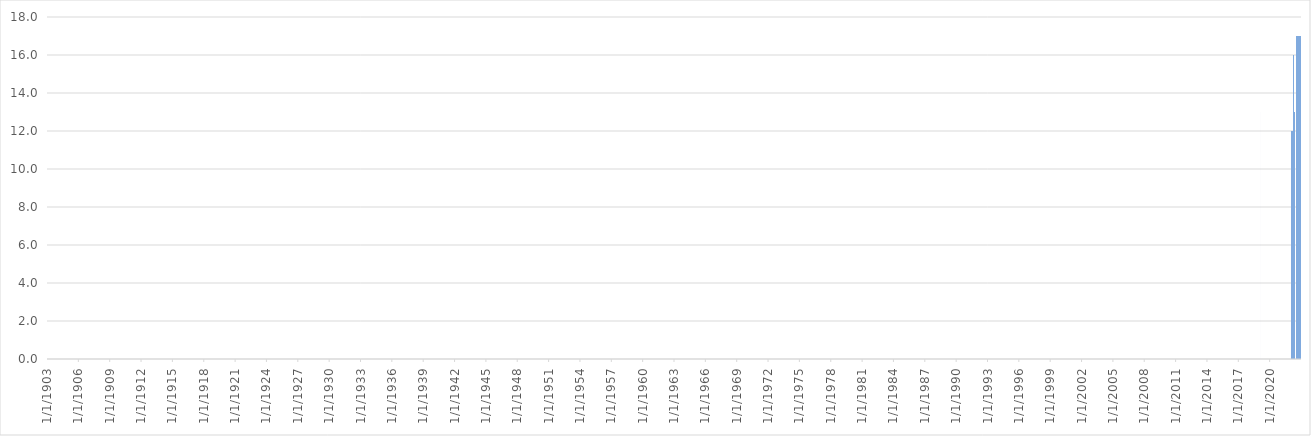
| Category | Series 0 |
|---|---|
| Dátum, idő | 0 |
| 2022.01.01. 00:15 | 10 |
| 2022.01.01. 00:30 | 10 |
| 2022.01.01. 00:45 | 10 |
| 2022.01.01. 01:00 | 10 |
| 2022.01.01. 01:15 | 10 |
| 2022.01.01. 01:30 | 10 |
| 2022.01.01. 01:45 | 10 |
| 2022.01.01. 02:00 | 10 |
| 2022.01.01. 02:15 | 10 |
| 2022.01.01. 02:30 | 10 |
| 2022.01.01. 02:45 | 10 |
| 2022.01.01. 03:00 | 10 |
| 2022.01.01. 03:15 | 10 |
| 2022.01.01. 03:30 | 10 |
| 2022.01.01. 03:45 | 10 |
| 2022.01.01. 04:00 | 10 |
| 2022.01.01. 04:15 | 10 |
| 2022.01.01. 04:30 | 10 |
| 2022.01.01. 04:45 | 10 |
| 2022.01.01. 05:00 | 10 |
| 2022.01.01. 05:15 | 10 |
| 2022.01.01. 05:30 | 10 |
| 2022.01.01. 05:45 | 10 |
| 2022.01.01. 06:00 | 10 |
| 2022.01.01. 06:15 | 10 |
| 2022.01.01. 06:30 | 10 |
| 2022.01.01. 06:45 | 10 |
| 2022.01.01. 07:00 | 10 |
| 2022.01.01. 07:15 | 10 |
| 2022.01.01. 07:30 | 10 |
| 2022.01.01. 07:45 | 10 |
| 2022.01.01. 08:00 | 10 |
| 2022.01.01. 08:15 | 10 |
| 2022.01.01. 08:30 | 10 |
| 2022.01.01. 08:45 | 10 |
| 2022.01.01. 09:00 | 10 |
| 2022.01.01. 09:15 | 10 |
| 2022.01.01. 09:30 | 10 |
| 2022.01.01. 09:45 | 10 |
| 2022.01.01. 10:00 | 10 |
| 2022.01.01. 10:15 | 10 |
| 2022.01.01. 10:30 | 10 |
| 2022.01.01. 10:45 | 10 |
| 2022.01.01. 11:00 | 10 |
| 2022.01.01. 11:15 | 10 |
| 2022.01.01. 11:30 | 10 |
| 2022.01.01. 11:45 | 10 |
| 2022.01.01. 12:00 | 10 |
| 2022.01.01. 12:15 | 10 |
| 2022.01.01. 12:30 | 10 |
| 2022.01.01. 12:45 | 10 |
| 2022.01.01. 13:00 | 10 |
| 2022.01.01. 13:15 | 10 |
| 2022.01.01. 13:30 | 10 |
| 2022.01.01. 13:45 | 10 |
| 2022.01.01. 14:00 | 10 |
| 2022.01.01. 14:15 | 10 |
| 2022.01.01. 14:30 | 10 |
| 2022.01.01. 14:45 | 10 |
| 2022.01.01. 15:00 | 10 |
| 2022.01.01. 15:15 | 10 |
| 2022.01.01. 15:30 | 10 |
| 2022.01.01. 15:45 | 10 |
| 2022.01.01. 16:00 | 10 |
| 2022.01.01. 16:15 | 10 |
| 2022.01.01. 16:30 | 10 |
| 2022.01.01. 16:45 | 10 |
| 2022.01.01. 17:00 | 10 |
| 2022.01.01. 17:15 | 10 |
| 2022.01.01. 17:30 | 10 |
| 2022.01.01. 17:45 | 10 |
| 2022.01.01. 18:00 | 10 |
| 2022.01.01. 18:15 | 10 |
| 2022.01.01. 18:30 | 10 |
| 2022.01.01. 18:45 | 10 |
| 2022.01.01. 19:00 | 10 |
| 2022.01.01. 19:15 | 10 |
| 2022.01.01. 19:30 | 10 |
| 2022.01.01. 19:45 | 10 |
| 2022.01.01. 20:00 | 10 |
| 2022.01.01. 20:15 | 10 |
| 2022.01.01. 20:30 | 10 |
| 2022.01.01. 20:45 | 10 |
| 2022.01.01. 21:00 | 10 |
| 2022.01.01. 21:15 | 10 |
| 2022.01.01. 21:30 | 10 |
| 2022.01.01. 21:45 | 10 |
| 2022.01.01. 22:00 | 10 |
| 2022.01.01. 22:15 | 10 |
| 2022.01.01. 22:30 | 10 |
| 2022.01.01. 22:45 | 10 |
| 2022.01.01. 23:00 | 10 |
| 2022.01.01. 23:15 | 10 |
| 2022.01.01. 23:30 | 10 |
| 2022.01.01. 23:45 | 10 |
| 2022.01.02. 00:00 | 10 |
| 2022.01.02. 00:15 | 10 |
| 2022.01.02. 00:30 | 10 |
| 2022.01.02. 00:45 | 10 |
| 2022.01.02. 01:00 | 10 |
| 2022.01.02. 01:15 | 10 |
| 2022.01.02. 01:30 | 10 |
| 2022.01.02. 01:45 | 10 |
| 2022.01.02. 02:00 | 10 |
| 2022.01.02. 02:15 | 10 |
| 2022.01.02. 02:30 | 10 |
| 2022.01.02. 02:45 | 10 |
| 2022.01.02. 03:00 | 10 |
| 2022.01.02. 03:15 | 10 |
| 2022.01.02. 03:30 | 10 |
| 2022.01.02. 03:45 | 10 |
| 2022.01.02. 04:00 | 10 |
| 2022.01.02. 04:15 | 10 |
| 2022.01.02. 04:30 | 10 |
| 2022.01.02. 04:45 | 10 |
| 2022.01.02. 05:00 | 10 |
| 2022.01.02. 05:15 | 10 |
| 2022.01.02. 05:30 | 10 |
| 2022.01.02. 05:45 | 10 |
| 2022.01.02. 06:00 | 10 |
| 2022.01.02. 06:15 | 10 |
| 2022.01.02. 06:30 | 10 |
| 2022.01.02. 06:45 | 10 |
| 2022.01.02. 07:00 | 10 |
| 2022.01.02. 07:15 | 10 |
| 2022.01.02. 07:30 | 10 |
| 2022.01.02. 07:45 | 10 |
| 2022.01.02. 08:00 | 10 |
| 2022.01.02. 08:15 | 10 |
| 2022.01.02. 08:30 | 10 |
| 2022.01.02. 08:45 | 10 |
| 2022.01.02. 09:00 | 10 |
| 2022.01.02. 09:15 | 10 |
| 2022.01.02. 09:30 | 10 |
| 2022.01.02. 09:45 | 10 |
| 2022.01.02. 10:00 | 10 |
| 2022.01.02. 10:15 | 10 |
| 2022.01.02. 10:30 | 10 |
| 2022.01.02. 10:45 | 10 |
| 2022.01.02. 11:00 | 10 |
| 2022.01.02. 11:15 | 10 |
| 2022.01.02. 11:30 | 10 |
| 2022.01.02. 11:45 | 10 |
| 2022.01.02. 12:00 | 10 |
| 2022.01.02. 12:15 | 10 |
| 2022.01.02. 12:30 | 10 |
| 2022.01.02. 12:45 | 10 |
| 2022.01.02. 13:00 | 10 |
| 2022.01.02. 13:15 | 10 |
| 2022.01.02. 13:30 | 10 |
| 2022.01.02. 13:45 | 10 |
| 2022.01.02. 14:00 | 10 |
| 2022.01.02. 14:15 | 10 |
| 2022.01.02. 14:30 | 10 |
| 2022.01.02. 14:45 | 10 |
| 2022.01.02. 15:00 | 10 |
| 2022.01.02. 15:15 | 10 |
| 2022.01.02. 15:30 | 10 |
| 2022.01.02. 15:45 | 10 |
| 2022.01.02. 16:00 | 10 |
| 2022.01.02. 16:15 | 10 |
| 2022.01.02. 16:30 | 10 |
| 2022.01.02. 16:45 | 10 |
| 2022.01.02. 17:00 | 10 |
| 2022.01.02. 17:15 | 10 |
| 2022.01.02. 17:30 | 10 |
| 2022.01.02. 17:45 | 10 |
| 2022.01.02. 18:00 | 10 |
| 2022.01.02. 18:15 | 10 |
| 2022.01.02. 18:30 | 10 |
| 2022.01.02. 18:45 | 10 |
| 2022.01.02. 19:00 | 10 |
| 2022.01.02. 19:15 | 10 |
| 2022.01.02. 19:30 | 10 |
| 2022.01.02. 19:45 | 10 |
| 2022.01.02. 20:00 | 10 |
| 2022.01.02. 20:15 | 10 |
| 2022.01.02. 20:30 | 10 |
| 2022.01.02. 20:45 | 10 |
| 2022.01.02. 21:00 | 10 |
| 2022.01.02. 21:15 | 10 |
| 2022.01.02. 21:30 | 10 |
| 2022.01.02. 21:45 | 10 |
| 2022.01.02. 22:00 | 10 |
| 2022.01.02. 22:15 | 10 |
| 2022.01.02. 22:30 | 10 |
| 2022.01.02. 22:45 | 10 |
| 2022.01.02. 23:00 | 10 |
| 2022.01.02. 23:15 | 10 |
| 2022.01.02. 23:30 | 10 |
| 2022.01.02. 23:45 | 10 |
| 2022.01.03. 00:00 | 10 |
| 2022.01.03. 00:15 | 10 |
| 2022.01.03. 00:30 | 10 |
| 2022.01.03. 00:45 | 10 |
| 2022.01.03. 01:00 | 10 |
| 2022.01.03. 01:15 | 10 |
| 2022.01.03. 01:30 | 10 |
| 2022.01.03. 01:45 | 10 |
| 2022.01.03. 02:00 | 10 |
| 2022.01.03. 02:15 | 10 |
| 2022.01.03. 02:30 | 10 |
| 2022.01.03. 02:45 | 10 |
| 2022.01.03. 03:00 | 10 |
| 2022.01.03. 03:15 | 10 |
| 2022.01.03. 03:30 | 10 |
| 2022.01.03. 03:45 | 10 |
| 2022.01.03. 04:00 | 10 |
| 2022.01.03. 04:15 | 10 |
| 2022.01.03. 04:30 | 10 |
| 2022.01.03. 04:45 | 10 |
| 2022.01.03. 05:00 | 10 |
| 2022.01.03. 05:15 | 10 |
| 2022.01.03. 05:30 | 10 |
| 2022.01.03. 05:45 | 10 |
| 2022.01.03. 06:00 | 10 |
| 2022.01.03. 06:15 | 10 |
| 2022.01.03. 06:30 | 10 |
| 2022.01.03. 06:45 | 10 |
| 2022.01.03. 07:00 | 10 |
| 2022.01.03. 07:15 | 10 |
| 2022.01.03. 07:30 | 10 |
| 2022.01.03. 07:45 | 10 |
| 2022.01.03. 08:00 | 10 |
| 2022.01.03. 08:15 | 10 |
| 2022.01.03. 08:30 | 10 |
| 2022.01.03. 08:45 | 10 |
| 2022.01.03. 09:00 | 10 |
| 2022.01.03. 09:15 | 10 |
| 2022.01.03. 09:30 | 10 |
| 2022.01.03. 09:45 | 10 |
| 2022.01.03. 10:00 | 10 |
| 2022.01.03. 10:15 | 10 |
| 2022.01.03. 10:30 | 10 |
| 2022.01.03. 10:45 | 10 |
| 2022.01.03. 11:00 | 10 |
| 2022.01.03. 11:15 | 10 |
| 2022.01.03. 11:30 | 10 |
| 2022.01.03. 11:45 | 10 |
| 2022.01.03. 12:00 | 10 |
| 2022.01.03. 12:15 | 10 |
| 2022.01.03. 12:30 | 10 |
| 2022.01.03. 12:45 | 10 |
| 2022.01.03. 13:00 | 10 |
| 2022.01.03. 13:15 | 10 |
| 2022.01.03. 13:30 | 10 |
| 2022.01.03. 13:45 | 10 |
| 2022.01.03. 14:00 | 10 |
| 2022.01.03. 14:15 | 10 |
| 2022.01.03. 14:30 | 10 |
| 2022.01.03. 14:45 | 10 |
| 2022.01.03. 15:00 | 10 |
| 2022.01.03. 15:15 | 10 |
| 2022.01.03. 15:30 | 10 |
| 2022.01.03. 15:45 | 10 |
| 2022.01.03. 16:00 | 10 |
| 2022.01.03. 16:15 | 10 |
| 2022.01.03. 16:30 | 10 |
| 2022.01.03. 16:45 | 10 |
| 2022.01.03. 17:00 | 10 |
| 2022.01.03. 17:15 | 10 |
| 2022.01.03. 17:30 | 10 |
| 2022.01.03. 17:45 | 10 |
| 2022.01.03. 18:00 | 10 |
| 2022.01.03. 18:15 | 10 |
| 2022.01.03. 18:30 | 10 |
| 2022.01.03. 18:45 | 10 |
| 2022.01.03. 19:00 | 10 |
| 2022.01.03. 19:15 | 10 |
| 2022.01.03. 19:30 | 10 |
| 2022.01.03. 19:45 | 10 |
| 2022.01.03. 20:00 | 10 |
| 2022.01.03. 20:15 | 10 |
| 2022.01.03. 20:30 | 10 |
| 2022.01.03. 20:45 | 10 |
| 2022.01.03. 21:00 | 10 |
| 2022.01.03. 21:15 | 10 |
| 2022.01.03. 21:30 | 10 |
| 2022.01.03. 21:45 | 10 |
| 2022.01.03. 22:00 | 10 |
| 2022.01.03. 22:15 | 10 |
| 2022.01.03. 22:30 | 10 |
| 2022.01.03. 22:45 | 10 |
| 2022.01.03. 23:00 | 10 |
| 2022.01.03. 23:15 | 10 |
| 2022.01.03. 23:30 | 10 |
| 2022.01.03. 23:45 | 10 |
| 2022.01.04. 00:00 | 10 |
| 2022.01.04. 00:15 | 10 |
| 2022.01.04. 00:30 | 10 |
| 2022.01.04. 00:45 | 10 |
| 2022.01.04. 01:00 | 10 |
| 2022.01.04. 01:15 | 10 |
| 2022.01.04. 01:30 | 10 |
| 2022.01.04. 01:45 | 10 |
| 2022.01.04. 02:00 | 10 |
| 2022.01.04. 02:15 | 10 |
| 2022.01.04. 02:30 | 10 |
| 2022.01.04. 02:45 | 10 |
| 2022.01.04. 03:00 | 10 |
| 2022.01.04. 03:15 | 10 |
| 2022.01.04. 03:30 | 10 |
| 2022.01.04. 03:45 | 10 |
| 2022.01.04. 04:00 | 10 |
| 2022.01.04. 04:15 | 10 |
| 2022.01.04. 04:30 | 10 |
| 2022.01.04. 04:45 | 10 |
| 2022.01.04. 05:00 | 10 |
| 2022.01.04. 05:15 | 10 |
| 2022.01.04. 05:30 | 10 |
| 2022.01.04. 05:45 | 10 |
| 2022.01.04. 06:00 | 10 |
| 2022.01.04. 06:15 | 10 |
| 2022.01.04. 06:30 | 10 |
| 2022.01.04. 06:45 | 10 |
| 2022.01.04. 07:00 | 10 |
| 2022.01.04. 07:15 | 10 |
| 2022.01.04. 07:30 | 10 |
| 2022.01.04. 07:45 | 10 |
| 2022.01.04. 08:00 | 10 |
| 2022.01.04. 08:15 | 10 |
| 2022.01.04. 08:30 | 10 |
| 2022.01.04. 08:45 | 10 |
| 2022.01.04. 09:00 | 10 |
| 2022.01.04. 09:15 | 10 |
| 2022.01.04. 09:30 | 10 |
| 2022.01.04. 09:45 | 10 |
| 2022.01.04. 10:00 | 10 |
| 2022.01.04. 10:15 | 10 |
| 2022.01.04. 10:30 | 10 |
| 2022.01.04. 10:45 | 10 |
| 2022.01.04. 11:00 | 10 |
| 2022.01.04. 11:15 | 10 |
| 2022.01.04. 11:30 | 10 |
| 2022.01.04. 11:45 | 10 |
| 2022.01.04. 12:00 | 10 |
| 2022.01.04. 12:15 | 10 |
| 2022.01.04. 12:30 | 10 |
| 2022.01.04. 12:45 | 10 |
| 2022.01.04. 13:00 | 10 |
| 2022.01.04. 13:15 | 10 |
| 2022.01.04. 13:30 | 10 |
| 2022.01.04. 13:45 | 10 |
| 2022.01.04. 14:00 | 10 |
| 2022.01.04. 14:15 | 10 |
| 2022.01.04. 14:30 | 10 |
| 2022.01.04. 14:45 | 10 |
| 2022.01.04. 15:00 | 10 |
| 2022.01.04. 15:15 | 10 |
| 2022.01.04. 15:30 | 10 |
| 2022.01.04. 15:45 | 10 |
| 2022.01.04. 16:00 | 10 |
| 2022.01.04. 16:15 | 10 |
| 2022.01.04. 16:30 | 10 |
| 2022.01.04. 16:45 | 10 |
| 2022.01.04. 17:00 | 10 |
| 2022.01.04. 17:15 | 10 |
| 2022.01.04. 17:30 | 10 |
| 2022.01.04. 17:45 | 10 |
| 2022.01.04. 18:00 | 10 |
| 2022.01.04. 18:15 | 10 |
| 2022.01.04. 18:30 | 10 |
| 2022.01.04. 18:45 | 10 |
| 2022.01.04. 19:00 | 10 |
| 2022.01.04. 19:15 | 10 |
| 2022.01.04. 19:30 | 10 |
| 2022.01.04. 19:45 | 10 |
| 2022.01.04. 20:00 | 10 |
| 2022.01.04. 20:15 | 10 |
| 2022.01.04. 20:30 | 10 |
| 2022.01.04. 20:45 | 10 |
| 2022.01.04. 21:00 | 10 |
| 2022.01.04. 21:15 | 10 |
| 2022.01.04. 21:30 | 10 |
| 2022.01.04. 21:45 | 10 |
| 2022.01.04. 22:00 | 10 |
| 2022.01.04. 22:15 | 10 |
| 2022.01.04. 22:30 | 10 |
| 2022.01.04. 22:45 | 10 |
| 2022.01.04. 23:00 | 10 |
| 2022.01.04. 23:15 | 10 |
| 2022.01.04. 23:30 | 10 |
| 2022.01.04. 23:45 | 10 |
| 2022.01.05. 00:00 | 10 |
| 2022.01.05. 00:15 | 10 |
| 2022.01.05. 00:30 | 10 |
| 2022.01.05. 00:45 | 10 |
| 2022.01.05. 01:00 | 10 |
| 2022.01.05. 01:15 | 10 |
| 2022.01.05. 01:30 | 10 |
| 2022.01.05. 01:45 | 10 |
| 2022.01.05. 02:00 | 10 |
| 2022.01.05. 02:15 | 10 |
| 2022.01.05. 02:30 | 10 |
| 2022.01.05. 02:45 | 10 |
| 2022.01.05. 03:00 | 10 |
| 2022.01.05. 03:15 | 10 |
| 2022.01.05. 03:30 | 10 |
| 2022.01.05. 03:45 | 10 |
| 2022.01.05. 04:00 | 10 |
| 2022.01.05. 04:15 | 10 |
| 2022.01.05. 04:30 | 10 |
| 2022.01.05. 04:45 | 10 |
| 2022.01.05. 05:00 | 10 |
| 2022.01.05. 05:15 | 10 |
| 2022.01.05. 05:30 | 10 |
| 2022.01.05. 05:45 | 10 |
| 2022.01.05. 06:00 | 10 |
| 2022.01.05. 06:15 | 10 |
| 2022.01.05. 06:30 | 10 |
| 2022.01.05. 06:45 | 10 |
| 2022.01.05. 07:00 | 10 |
| 2022.01.05. 07:15 | 10 |
| 2022.01.05. 07:30 | 10 |
| 2022.01.05. 07:45 | 10 |
| 2022.01.05. 08:00 | 10 |
| 2022.01.05. 08:15 | 10 |
| 2022.01.05. 08:30 | 10 |
| 2022.01.05. 08:45 | 10 |
| 2022.01.05. 09:00 | 10 |
| 2022.01.05. 09:15 | 10 |
| 2022.01.05. 09:30 | 10 |
| 2022.01.05. 09:45 | 10 |
| 2022.01.05. 10:00 | 10 |
| 2022.01.05. 10:15 | 10 |
| 2022.01.05. 10:30 | 10 |
| 2022.01.05. 10:45 | 10 |
| 2022.01.05. 11:00 | 10 |
| 2022.01.05. 11:15 | 10 |
| 2022.01.05. 11:30 | 10 |
| 2022.01.05. 11:45 | 10 |
| 2022.01.05. 12:00 | 10 |
| 2022.01.05. 12:15 | 10 |
| 2022.01.05. 12:30 | 10 |
| 2022.01.05. 12:45 | 10 |
| 2022.01.05. 13:00 | 10 |
| 2022.01.05. 13:15 | 10 |
| 2022.01.05. 13:30 | 10 |
| 2022.01.05. 13:45 | 10 |
| 2022.01.05. 14:00 | 10 |
| 2022.01.05. 14:15 | 10 |
| 2022.01.05. 14:30 | 10 |
| 2022.01.05. 14:45 | 10 |
| 2022.01.05. 15:00 | 10 |
| 2022.01.05. 15:15 | 10 |
| 2022.01.05. 15:30 | 10 |
| 2022.01.05. 15:45 | 10 |
| 2022.01.05. 16:00 | 10 |
| 2022.01.05. 16:15 | 10 |
| 2022.01.05. 16:30 | 10 |
| 2022.01.05. 16:45 | 10 |
| 2022.01.05. 17:00 | 10 |
| 2022.01.05. 17:15 | 10 |
| 2022.01.05. 17:30 | 10 |
| 2022.01.05. 17:45 | 10 |
| 2022.01.05. 18:00 | 10 |
| 2022.01.05. 18:15 | 10 |
| 2022.01.05. 18:30 | 10 |
| 2022.01.05. 18:45 | 10 |
| 2022.01.05. 19:00 | 10 |
| 2022.01.05. 19:15 | 10 |
| 2022.01.05. 19:30 | 10 |
| 2022.01.05. 19:45 | 10 |
| 2022.01.05. 20:00 | 10 |
| 2022.01.05. 20:15 | 10 |
| 2022.01.05. 20:30 | 10 |
| 2022.01.05. 20:45 | 10 |
| 2022.01.05. 21:00 | 10 |
| 2022.01.05. 21:15 | 10 |
| 2022.01.05. 21:30 | 10 |
| 2022.01.05. 21:45 | 10 |
| 2022.01.05. 22:00 | 10 |
| 2022.01.05. 22:15 | 10 |
| 2022.01.05. 22:30 | 10 |
| 2022.01.05. 22:45 | 10 |
| 2022.01.05. 23:00 | 10 |
| 2022.01.05. 23:15 | 10 |
| 2022.01.05. 23:30 | 10 |
| 2022.01.05. 23:45 | 10 |
| 2022.01.06. 00:00 | 10 |
| 2022.01.06. 00:15 | 10 |
| 2022.01.06. 00:30 | 10 |
| 2022.01.06. 00:45 | 10 |
| 2022.01.06. 01:00 | 10 |
| 2022.01.06. 01:15 | 10 |
| 2022.01.06. 01:30 | 10 |
| 2022.01.06. 01:45 | 10 |
| 2022.01.06. 02:00 | 10 |
| 2022.01.06. 02:15 | 10 |
| 2022.01.06. 02:30 | 10 |
| 2022.01.06. 02:45 | 10 |
| 2022.01.06. 03:00 | 10 |
| 2022.01.06. 03:15 | 10 |
| 2022.01.06. 03:30 | 10 |
| 2022.01.06. 03:45 | 10 |
| 2022.01.06. 04:00 | 10 |
| 2022.01.06. 04:15 | 10 |
| 2022.01.06. 04:30 | 10 |
| 2022.01.06. 04:45 | 10 |
| 2022.01.06. 05:00 | 10 |
| 2022.01.06. 05:15 | 10 |
| 2022.01.06. 05:30 | 10 |
| 2022.01.06. 05:45 | 10 |
| 2022.01.06. 06:00 | 10 |
| 2022.01.06. 06:15 | 10 |
| 2022.01.06. 06:30 | 10 |
| 2022.01.06. 06:45 | 10 |
| 2022.01.06. 07:00 | 10 |
| 2022.01.06. 07:15 | 10 |
| 2022.01.06. 07:30 | 10 |
| 2022.01.06. 07:45 | 10 |
| 2022.01.06. 08:00 | 10 |
| 2022.01.06. 08:15 | 10 |
| 2022.01.06. 08:30 | 10 |
| 2022.01.06. 08:45 | 10 |
| 2022.01.06. 09:00 | 10 |
| 2022.01.06. 09:15 | 10 |
| 2022.01.06. 09:30 | 10 |
| 2022.01.06. 09:45 | 10 |
| 2022.01.06. 10:00 | 10 |
| 2022.01.06. 10:15 | 10 |
| 2022.01.06. 10:30 | 10 |
| 2022.01.06. 10:45 | 10 |
| 2022.01.06. 11:00 | 10 |
| 2022.01.06. 11:15 | 10 |
| 2022.01.06. 11:30 | 10 |
| 2022.01.06. 11:45 | 10 |
| 2022.01.06. 12:00 | 10 |
| 2022.01.06. 12:15 | 10 |
| 2022.01.06. 12:30 | 10 |
| 2022.01.06. 12:45 | 10 |
| 2022.01.06. 13:00 | 10 |
| 2022.01.06. 13:15 | 10 |
| 2022.01.06. 13:30 | 10 |
| 2022.01.06. 13:45 | 10 |
| 2022.01.06. 14:00 | 10 |
| 2022.01.06. 14:15 | 10 |
| 2022.01.06. 14:30 | 10 |
| 2022.01.06. 14:45 | 10 |
| 2022.01.06. 15:00 | 10 |
| 2022.01.06. 15:15 | 10 |
| 2022.01.06. 15:30 | 10 |
| 2022.01.06. 15:45 | 10 |
| 2022.01.06. 16:00 | 10 |
| 2022.01.06. 16:15 | 10 |
| 2022.01.06. 16:30 | 10 |
| 2022.01.06. 16:45 | 10 |
| 2022.01.06. 17:00 | 10 |
| 2022.01.06. 17:15 | 10 |
| 2022.01.06. 17:30 | 10 |
| 2022.01.06. 17:45 | 10 |
| 2022.01.06. 18:00 | 10 |
| 2022.01.06. 18:15 | 10 |
| 2022.01.06. 18:30 | 10 |
| 2022.01.06. 18:45 | 10 |
| 2022.01.06. 19:00 | 10 |
| 2022.01.06. 19:15 | 10 |
| 2022.01.06. 19:30 | 10 |
| 2022.01.06. 19:45 | 10 |
| 2022.01.06. 20:00 | 10 |
| 2022.01.06. 20:15 | 10 |
| 2022.01.06. 20:30 | 10 |
| 2022.01.06. 20:45 | 10 |
| 2022.01.06. 21:00 | 10 |
| 2022.01.06. 21:15 | 10 |
| 2022.01.06. 21:30 | 10 |
| 2022.01.06. 21:45 | 10 |
| 2022.01.06. 22:00 | 10 |
| 2022.01.06. 22:15 | 10 |
| 2022.01.06. 22:30 | 10 |
| 2022.01.06. 22:45 | 10 |
| 2022.01.06. 23:00 | 10 |
| 2022.01.06. 23:15 | 10 |
| 2022.01.06. 23:30 | 10 |
| 2022.01.06. 23:45 | 10 |
| 2022.01.07. 00:00 | 10 |
| 2022.01.07. 00:15 | 10 |
| 2022.01.07. 00:30 | 10 |
| 2022.01.07. 00:45 | 10 |
| 2022.01.07. 01:00 | 10 |
| 2022.01.07. 01:15 | 10 |
| 2022.01.07. 01:30 | 10 |
| 2022.01.07. 01:45 | 10 |
| 2022.01.07. 02:00 | 10 |
| 2022.01.07. 02:15 | 10 |
| 2022.01.07. 02:30 | 10 |
| 2022.01.07. 02:45 | 10 |
| 2022.01.07. 03:00 | 10 |
| 2022.01.07. 03:15 | 10 |
| 2022.01.07. 03:30 | 10 |
| 2022.01.07. 03:45 | 10 |
| 2022.01.07. 04:00 | 10 |
| 2022.01.07. 04:15 | 10 |
| 2022.01.07. 04:30 | 10 |
| 2022.01.07. 04:45 | 10 |
| 2022.01.07. 05:00 | 10 |
| 2022.01.07. 05:15 | 10 |
| 2022.01.07. 05:30 | 10 |
| 2022.01.07. 05:45 | 10 |
| 2022.01.07. 06:00 | 10 |
| 2022.01.07. 06:15 | 10 |
| 2022.01.07. 06:30 | 10 |
| 2022.01.07. 06:45 | 10 |
| 2022.01.07. 07:00 | 10 |
| 2022.01.07. 07:15 | 10 |
| 2022.01.07. 07:30 | 10 |
| 2022.01.07. 07:45 | 10 |
| 2022.01.07. 08:00 | 10 |
| 2022.01.07. 08:15 | 10 |
| 2022.01.07. 08:30 | 10 |
| 2022.01.07. 08:45 | 10 |
| 2022.01.07. 09:00 | 10 |
| 2022.01.07. 09:15 | 10 |
| 2022.01.07. 09:30 | 10 |
| 2022.01.07. 09:45 | 10 |
| 2022.01.07. 10:00 | 10 |
| 2022.01.07. 10:15 | 10 |
| 2022.01.07. 10:30 | 10 |
| 2022.01.07. 10:45 | 10 |
| 2022.01.07. 11:00 | 10 |
| 2022.01.07. 11:15 | 10 |
| 2022.01.07. 11:30 | 10 |
| 2022.01.07. 11:45 | 10 |
| 2022.01.07. 12:00 | 10 |
| 2022.01.07. 12:15 | 10 |
| 2022.01.07. 12:30 | 10 |
| 2022.01.07. 12:45 | 10 |
| 2022.01.07. 13:00 | 10 |
| 2022.01.07. 13:15 | 10 |
| 2022.01.07. 13:30 | 10 |
| 2022.01.07. 13:45 | 10 |
| 2022.01.07. 14:00 | 10 |
| 2022.01.07. 14:15 | 10 |
| 2022.01.07. 14:30 | 10 |
| 2022.01.07. 14:45 | 10 |
| 2022.01.07. 15:00 | 10 |
| 2022.01.07. 15:15 | 10 |
| 2022.01.07. 15:30 | 10 |
| 2022.01.07. 15:45 | 10 |
| 2022.01.07. 16:00 | 10 |
| 2022.01.07. 16:15 | 10 |
| 2022.01.07. 16:30 | 10 |
| 2022.01.07. 16:45 | 10 |
| 2022.01.07. 17:00 | 10 |
| 2022.01.07. 17:15 | 10 |
| 2022.01.07. 17:30 | 10 |
| 2022.01.07. 17:45 | 10 |
| 2022.01.07. 18:00 | 10 |
| 2022.01.07. 18:15 | 10 |
| 2022.01.07. 18:30 | 10 |
| 2022.01.07. 18:45 | 10 |
| 2022.01.07. 19:00 | 10 |
| 2022.01.07. 19:15 | 10 |
| 2022.01.07. 19:30 | 10 |
| 2022.01.07. 19:45 | 10 |
| 2022.01.07. 20:00 | 10 |
| 2022.01.07. 20:15 | 10 |
| 2022.01.07. 20:30 | 10 |
| 2022.01.07. 20:45 | 10 |
| 2022.01.07. 21:00 | 10 |
| 2022.01.07. 21:15 | 10 |
| 2022.01.07. 21:30 | 10 |
| 2022.01.07. 21:45 | 10 |
| 2022.01.07. 22:00 | 10 |
| 2022.01.07. 22:15 | 10 |
| 2022.01.07. 22:30 | 10 |
| 2022.01.07. 22:45 | 10 |
| 2022.01.07. 23:00 | 10 |
| 2022.01.07. 23:15 | 10 |
| 2022.01.07. 23:30 | 10 |
| 2022.01.07. 23:45 | 10 |
| 2022.01.08. 00:00 | 10 |
| 2022.01.08. 00:15 | 10 |
| 2022.01.08. 00:30 | 10 |
| 2022.01.08. 00:45 | 10 |
| 2022.01.08. 01:00 | 10 |
| 2022.01.08. 01:15 | 10 |
| 2022.01.08. 01:30 | 10 |
| 2022.01.08. 01:45 | 10 |
| 2022.01.08. 02:00 | 10 |
| 2022.01.08. 02:15 | 10 |
| 2022.01.08. 02:30 | 10 |
| 2022.01.08. 02:45 | 10 |
| 2022.01.08. 03:00 | 10 |
| 2022.01.08. 03:15 | 10 |
| 2022.01.08. 03:30 | 10 |
| 2022.01.08. 03:45 | 10 |
| 2022.01.08. 04:00 | 10 |
| 2022.01.08. 04:15 | 10 |
| 2022.01.08. 04:30 | 10 |
| 2022.01.08. 04:45 | 10 |
| 2022.01.08. 05:00 | 10 |
| 2022.01.08. 05:15 | 10 |
| 2022.01.08. 05:30 | 10 |
| 2022.01.08. 05:45 | 10 |
| 2022.01.08. 06:00 | 10 |
| 2022.01.08. 06:15 | 10 |
| 2022.01.08. 06:30 | 10 |
| 2022.01.08. 06:45 | 10 |
| 2022.01.08. 07:00 | 10 |
| 2022.01.08. 07:15 | 10 |
| 2022.01.08. 07:30 | 10 |
| 2022.01.08. 07:45 | 10 |
| 2022.01.08. 08:00 | 10 |
| 2022.01.08. 08:15 | 10 |
| 2022.01.08. 08:30 | 10 |
| 2022.01.08. 08:45 | 10 |
| 2022.01.08. 09:00 | 10 |
| 2022.01.08. 09:15 | 10 |
| 2022.01.08. 09:30 | 10 |
| 2022.01.08. 09:45 | 10 |
| 2022.01.08. 10:00 | 10 |
| 2022.01.08. 10:15 | 10 |
| 2022.01.08. 10:30 | 10 |
| 2022.01.08. 10:45 | 10 |
| 2022.01.08. 11:00 | 10 |
| 2022.01.08. 11:15 | 10 |
| 2022.01.08. 11:30 | 10 |
| 2022.01.08. 11:45 | 10 |
| 2022.01.08. 12:00 | 10 |
| 2022.01.08. 12:15 | 10 |
| 2022.01.08. 12:30 | 10 |
| 2022.01.08. 12:45 | 10 |
| 2022.01.08. 13:00 | 10 |
| 2022.01.08. 13:15 | 10 |
| 2022.01.08. 13:30 | 10 |
| 2022.01.08. 13:45 | 10 |
| 2022.01.08. 14:00 | 10 |
| 2022.01.08. 14:15 | 10 |
| 2022.01.08. 14:30 | 10 |
| 2022.01.08. 14:45 | 10 |
| 2022.01.08. 15:00 | 10 |
| 2022.01.08. 15:15 | 10 |
| 2022.01.08. 15:30 | 10 |
| 2022.01.08. 15:45 | 10 |
| 2022.01.08. 16:00 | 10 |
| 2022.01.08. 16:15 | 10 |
| 2022.01.08. 16:30 | 10 |
| 2022.01.08. 16:45 | 10 |
| 2022.01.08. 17:00 | 10 |
| 2022.01.08. 17:15 | 10 |
| 2022.01.08. 17:30 | 10 |
| 2022.01.08. 17:45 | 10 |
| 2022.01.08. 18:00 | 10 |
| 2022.01.08. 18:15 | 10 |
| 2022.01.08. 18:30 | 10 |
| 2022.01.08. 18:45 | 10 |
| 2022.01.08. 19:00 | 10 |
| 2022.01.08. 19:15 | 10 |
| 2022.01.08. 19:30 | 10 |
| 2022.01.08. 19:45 | 10 |
| 2022.01.08. 20:00 | 10 |
| 2022.01.08. 20:15 | 10 |
| 2022.01.08. 20:30 | 10 |
| 2022.01.08. 20:45 | 10 |
| 2022.01.08. 21:00 | 10 |
| 2022.01.08. 21:15 | 10 |
| 2022.01.08. 21:30 | 10 |
| 2022.01.08. 21:45 | 10 |
| 2022.01.08. 22:00 | 10 |
| 2022.01.08. 22:15 | 10 |
| 2022.01.08. 22:30 | 10 |
| 2022.01.08. 22:45 | 10 |
| 2022.01.08. 23:00 | 10 |
| 2022.01.08. 23:15 | 10 |
| 2022.01.08. 23:30 | 10 |
| 2022.01.08. 23:45 | 10 |
| 2022.01.09. 00:00 | 10 |
| 2022.01.09. 00:15 | 10 |
| 2022.01.09. 00:30 | 10 |
| 2022.01.09. 00:45 | 10 |
| 2022.01.09. 01:00 | 10 |
| 2022.01.09. 01:15 | 10 |
| 2022.01.09. 01:30 | 10 |
| 2022.01.09. 01:45 | 10 |
| 2022.01.09. 02:00 | 10 |
| 2022.01.09. 02:15 | 10 |
| 2022.01.09. 02:30 | 10 |
| 2022.01.09. 02:45 | 10 |
| 2022.01.09. 03:00 | 10 |
| 2022.01.09. 03:15 | 10 |
| 2022.01.09. 03:30 | 10 |
| 2022.01.09. 03:45 | 10 |
| 2022.01.09. 04:00 | 10 |
| 2022.01.09. 04:15 | 10 |
| 2022.01.09. 04:30 | 10 |
| 2022.01.09. 04:45 | 10 |
| 2022.01.09. 05:00 | 10 |
| 2022.01.09. 05:15 | 10 |
| 2022.01.09. 05:30 | 10 |
| 2022.01.09. 05:45 | 10 |
| 2022.01.09. 06:00 | 10 |
| 2022.01.09. 06:15 | 10 |
| 2022.01.09. 06:30 | 10 |
| 2022.01.09. 06:45 | 10 |
| 2022.01.09. 07:00 | 10 |
| 2022.01.09. 07:15 | 10 |
| 2022.01.09. 07:30 | 10 |
| 2022.01.09. 07:45 | 10 |
| 2022.01.09. 08:00 | 10 |
| 2022.01.09. 08:15 | 10 |
| 2022.01.09. 08:30 | 10 |
| 2022.01.09. 08:45 | 10 |
| 2022.01.09. 09:00 | 10 |
| 2022.01.09. 09:15 | 10 |
| 2022.01.09. 09:30 | 10 |
| 2022.01.09. 09:45 | 10 |
| 2022.01.09. 10:00 | 10 |
| 2022.01.09. 10:15 | 10 |
| 2022.01.09. 10:30 | 10 |
| 2022.01.09. 10:45 | 10 |
| 2022.01.09. 11:00 | 10 |
| 2022.01.09. 11:15 | 10 |
| 2022.01.09. 11:30 | 10 |
| 2022.01.09. 11:45 | 10 |
| 2022.01.09. 12:00 | 10 |
| 2022.01.09. 12:15 | 10 |
| 2022.01.09. 12:30 | 10 |
| 2022.01.09. 12:45 | 10 |
| 2022.01.09. 13:00 | 10 |
| 2022.01.09. 13:15 | 10 |
| 2022.01.09. 13:30 | 10 |
| 2022.01.09. 13:45 | 10 |
| 2022.01.09. 14:00 | 10 |
| 2022.01.09. 14:15 | 10 |
| 2022.01.09. 14:30 | 10 |
| 2022.01.09. 14:45 | 10 |
| 2022.01.09. 15:00 | 10 |
| 2022.01.09. 15:15 | 10 |
| 2022.01.09. 15:30 | 10 |
| 2022.01.09. 15:45 | 10 |
| 2022.01.09. 16:00 | 10 |
| 2022.01.09. 16:15 | 10 |
| 2022.01.09. 16:30 | 10 |
| 2022.01.09. 16:45 | 10 |
| 2022.01.09. 17:00 | 10 |
| 2022.01.09. 17:15 | 10 |
| 2022.01.09. 17:30 | 10 |
| 2022.01.09. 17:45 | 10 |
| 2022.01.09. 18:00 | 10 |
| 2022.01.09. 18:15 | 10 |
| 2022.01.09. 18:30 | 10 |
| 2022.01.09. 18:45 | 10 |
| 2022.01.09. 19:00 | 10 |
| 2022.01.09. 19:15 | 10 |
| 2022.01.09. 19:30 | 10 |
| 2022.01.09. 19:45 | 10 |
| 2022.01.09. 20:00 | 10 |
| 2022.01.09. 20:15 | 10 |
| 2022.01.09. 20:30 | 10 |
| 2022.01.09. 20:45 | 10 |
| 2022.01.09. 21:00 | 10 |
| 2022.01.09. 21:15 | 10 |
| 2022.01.09. 21:30 | 10 |
| 2022.01.09. 21:45 | 10 |
| 2022.01.09. 22:00 | 10 |
| 2022.01.09. 22:15 | 10 |
| 2022.01.09. 22:30 | 10 |
| 2022.01.09. 22:45 | 10 |
| 2022.01.09. 23:00 | 10 |
| 2022.01.09. 23:15 | 10 |
| 2022.01.09. 23:30 | 10 |
| 2022.01.09. 23:45 | 10 |
| 2022.01.10. 00:00 | 10 |
| 2022.01.10. 00:15 | 10 |
| 2022.01.10. 00:30 | 10 |
| 2022.01.10. 00:45 | 10 |
| 2022.01.10. 01:00 | 10 |
| 2022.01.10. 01:15 | 10 |
| 2022.01.10. 01:30 | 10 |
| 2022.01.10. 01:45 | 10 |
| 2022.01.10. 02:00 | 10 |
| 2022.01.10. 02:15 | 10 |
| 2022.01.10. 02:30 | 10 |
| 2022.01.10. 02:45 | 10 |
| 2022.01.10. 03:00 | 10 |
| 2022.01.10. 03:15 | 10 |
| 2022.01.10. 03:30 | 10 |
| 2022.01.10. 03:45 | 10 |
| 2022.01.10. 04:00 | 10 |
| 2022.01.10. 04:15 | 10 |
| 2022.01.10. 04:30 | 10 |
| 2022.01.10. 04:45 | 10 |
| 2022.01.10. 05:00 | 10 |
| 2022.01.10. 05:15 | 10 |
| 2022.01.10. 05:30 | 10 |
| 2022.01.10. 05:45 | 10 |
| 2022.01.10. 06:00 | 10 |
| 2022.01.10. 06:15 | 10 |
| 2022.01.10. 06:30 | 10 |
| 2022.01.10. 06:45 | 10 |
| 2022.01.10. 07:00 | 10 |
| 2022.01.10. 07:15 | 10 |
| 2022.01.10. 07:30 | 10 |
| 2022.01.10. 07:45 | 10 |
| 2022.01.10. 08:00 | 10 |
| 2022.01.10. 08:15 | 10 |
| 2022.01.10. 08:30 | 10 |
| 2022.01.10. 08:45 | 10 |
| 2022.01.10. 09:00 | 10 |
| 2022.01.10. 09:15 | 10 |
| 2022.01.10. 09:30 | 10 |
| 2022.01.10. 09:45 | 10 |
| 2022.01.10. 10:00 | 10 |
| 2022.01.10. 10:15 | 10 |
| 2022.01.10. 10:30 | 10 |
| 2022.01.10. 10:45 | 10 |
| 2022.01.10. 11:00 | 10 |
| 2022.01.10. 11:15 | 10 |
| 2022.01.10. 11:30 | 10 |
| 2022.01.10. 11:45 | 10 |
| 2022.01.10. 12:00 | 10 |
| 2022.01.10. 12:15 | 10 |
| 2022.01.10. 12:30 | 10 |
| 2022.01.10. 12:45 | 10 |
| 2022.01.10. 13:00 | 10 |
| 2022.01.10. 13:15 | 10 |
| 2022.01.10. 13:30 | 10 |
| 2022.01.10. 13:45 | 10 |
| 2022.01.10. 14:00 | 10 |
| 2022.01.10. 14:15 | 10 |
| 2022.01.10. 14:30 | 10 |
| 2022.01.10. 14:45 | 10 |
| 2022.01.10. 15:00 | 10 |
| 2022.01.10. 15:15 | 10 |
| 2022.01.10. 15:30 | 10 |
| 2022.01.10. 15:45 | 10 |
| 2022.01.10. 16:00 | 10 |
| 2022.01.10. 16:15 | 10 |
| 2022.01.10. 16:30 | 10 |
| 2022.01.10. 16:45 | 10 |
| 2022.01.10. 17:00 | 10 |
| 2022.01.10. 17:15 | 10 |
| 2022.01.10. 17:30 | 10 |
| 2022.01.10. 17:45 | 10 |
| 2022.01.10. 18:00 | 10 |
| 2022.01.10. 18:15 | 10 |
| 2022.01.10. 18:30 | 10 |
| 2022.01.10. 18:45 | 10 |
| 2022.01.10. 19:00 | 10 |
| 2022.01.10. 19:15 | 10 |
| 2022.01.10. 19:30 | 10 |
| 2022.01.10. 19:45 | 10 |
| 2022.01.10. 20:00 | 10 |
| 2022.01.10. 20:15 | 10 |
| 2022.01.10. 20:30 | 10 |
| 2022.01.10. 20:45 | 10 |
| 2022.01.10. 21:00 | 10 |
| 2022.01.10. 21:15 | 10 |
| 2022.01.10. 21:30 | 10 |
| 2022.01.10. 21:45 | 10 |
| 2022.01.10. 22:00 | 10 |
| 2022.01.10. 22:15 | 10 |
| 2022.01.10. 22:30 | 10 |
| 2022.01.10. 22:45 | 10 |
| 2022.01.10. 23:00 | 10 |
| 2022.01.10. 23:15 | 10 |
| 2022.01.10. 23:30 | 10 |
| 2022.01.10. 23:45 | 10 |
| 2022.01.11. 00:00 | 10 |
| 2022.01.11. 00:15 | 10 |
| 2022.01.11. 00:30 | 10 |
| 2022.01.11. 00:45 | 10 |
| 2022.01.11. 01:00 | 10 |
| 2022.01.11. 01:15 | 10 |
| 2022.01.11. 01:30 | 10 |
| 2022.01.11. 01:45 | 10 |
| 2022.01.11. 02:00 | 10 |
| 2022.01.11. 02:15 | 10 |
| 2022.01.11. 02:30 | 10 |
| 2022.01.11. 02:45 | 10 |
| 2022.01.11. 03:00 | 10 |
| 2022.01.11. 03:15 | 10 |
| 2022.01.11. 03:30 | 10 |
| 2022.01.11. 03:45 | 10 |
| 2022.01.11. 04:00 | 10 |
| 2022.01.11. 04:15 | 10 |
| 2022.01.11. 04:30 | 10 |
| 2022.01.11. 04:45 | 10 |
| 2022.01.11. 05:00 | 10 |
| 2022.01.11. 05:15 | 10 |
| 2022.01.11. 05:30 | 10 |
| 2022.01.11. 05:45 | 10 |
| 2022.01.11. 06:00 | 10 |
| 2022.01.11. 06:15 | 10 |
| 2022.01.11. 06:30 | 10 |
| 2022.01.11. 06:45 | 10 |
| 2022.01.11. 07:00 | 10 |
| 2022.01.11. 07:15 | 10 |
| 2022.01.11. 07:30 | 10 |
| 2022.01.11. 07:45 | 10 |
| 2022.01.11. 08:00 | 10 |
| 2022.01.11. 08:15 | 10 |
| 2022.01.11. 08:30 | 10 |
| 2022.01.11. 08:45 | 10 |
| 2022.01.11. 09:00 | 10 |
| 2022.01.11. 09:15 | 10 |
| 2022.01.11. 09:30 | 10 |
| 2022.01.11. 09:45 | 10 |
| 2022.01.11. 10:00 | 10 |
| 2022.01.11. 10:15 | 10 |
| 2022.01.11. 10:30 | 10 |
| 2022.01.11. 10:45 | 10 |
| 2022.01.11. 11:00 | 10 |
| 2022.01.11. 11:15 | 10 |
| 2022.01.11. 11:30 | 10 |
| 2022.01.11. 11:45 | 10 |
| 2022.01.11. 12:00 | 10 |
| 2022.01.11. 12:15 | 10 |
| 2022.01.11. 12:30 | 10 |
| 2022.01.11. 12:45 | 10 |
| 2022.01.11. 13:00 | 10 |
| 2022.01.11. 13:15 | 10 |
| 2022.01.11. 13:30 | 10 |
| 2022.01.11. 13:45 | 10 |
| 2022.01.11. 14:00 | 10 |
| 2022.01.11. 14:15 | 10 |
| 2022.01.11. 14:30 | 10 |
| 2022.01.11. 14:45 | 10 |
| 2022.01.11. 15:00 | 10 |
| 2022.01.11. 15:15 | 10 |
| 2022.01.11. 15:30 | 10 |
| 2022.01.11. 15:45 | 10 |
| 2022.01.11. 16:00 | 10 |
| 2022.01.11. 16:15 | 10 |
| 2022.01.11. 16:30 | 10 |
| 2022.01.11. 16:45 | 10 |
| 2022.01.11. 17:00 | 10 |
| 2022.01.11. 17:15 | 10 |
| 2022.01.11. 17:30 | 10 |
| 2022.01.11. 17:45 | 10 |
| 2022.01.11. 18:00 | 10 |
| 2022.01.11. 18:15 | 10 |
| 2022.01.11. 18:30 | 10 |
| 2022.01.11. 18:45 | 10 |
| 2022.01.11. 19:00 | 10 |
| 2022.01.11. 19:15 | 10 |
| 2022.01.11. 19:30 | 10 |
| 2022.01.11. 19:45 | 10 |
| 2022.01.11. 20:00 | 10 |
| 2022.01.11. 20:15 | 10 |
| 2022.01.11. 20:30 | 10 |
| 2022.01.11. 20:45 | 10 |
| 2022.01.11. 21:00 | 10 |
| 2022.01.11. 21:15 | 10 |
| 2022.01.11. 21:30 | 10 |
| 2022.01.11. 21:45 | 10 |
| 2022.01.11. 22:00 | 10 |
| 2022.01.11. 22:15 | 10 |
| 2022.01.11. 22:30 | 10 |
| 2022.01.11. 22:45 | 10 |
| 2022.01.11. 23:00 | 10 |
| 2022.01.11. 23:15 | 10 |
| 2022.01.11. 23:30 | 10 |
| 2022.01.11. 23:45 | 10 |
| 2022.01.12. 00:00 | 10 |
| 2022.01.12. 00:15 | 10 |
| 2022.01.12. 00:30 | 10 |
| 2022.01.12. 00:45 | 10 |
| 2022.01.12. 01:00 | 10 |
| 2022.01.12. 01:15 | 10 |
| 2022.01.12. 01:30 | 10 |
| 2022.01.12. 01:45 | 10 |
| 2022.01.12. 02:00 | 10 |
| 2022.01.12. 02:15 | 10 |
| 2022.01.12. 02:30 | 10 |
| 2022.01.12. 02:45 | 10 |
| 2022.01.12. 03:00 | 10 |
| 2022.01.12. 03:15 | 10 |
| 2022.01.12. 03:30 | 10 |
| 2022.01.12. 03:45 | 10 |
| 2022.01.12. 04:00 | 10 |
| 2022.01.12. 04:15 | 10 |
| 2022.01.12. 04:30 | 10 |
| 2022.01.12. 04:45 | 10 |
| 2022.01.12. 05:00 | 10 |
| 2022.01.12. 05:15 | 10 |
| 2022.01.12. 05:30 | 10 |
| 2022.01.12. 05:45 | 10 |
| 2022.01.12. 06:00 | 10 |
| 2022.01.12. 06:15 | 10 |
| 2022.01.12. 06:30 | 10 |
| 2022.01.12. 06:45 | 10 |
| 2022.01.12. 07:00 | 10 |
| 2022.01.12. 07:15 | 10 |
| 2022.01.12. 07:30 | 10 |
| 2022.01.12. 07:45 | 10 |
| 2022.01.12. 08:00 | 10 |
| 2022.01.12. 08:15 | 10 |
| 2022.01.12. 08:30 | 10 |
| 2022.01.12. 08:45 | 10 |
| 2022.01.12. 09:00 | 10 |
| 2022.01.12. 09:15 | 10 |
| 2022.01.12. 09:30 | 10 |
| 2022.01.12. 09:45 | 10 |
| 2022.01.12. 10:00 | 10 |
| 2022.01.12. 10:15 | 10 |
| 2022.01.12. 10:30 | 10 |
| 2022.01.12. 10:45 | 10 |
| 2022.01.12. 11:00 | 10 |
| 2022.01.12. 11:15 | 10 |
| 2022.01.12. 11:30 | 10 |
| 2022.01.12. 11:45 | 10 |
| 2022.01.12. 12:00 | 10 |
| 2022.01.12. 12:15 | 10 |
| 2022.01.12. 12:30 | 10 |
| 2022.01.12. 12:45 | 10 |
| 2022.01.12. 13:00 | 10 |
| 2022.01.12. 13:15 | 10 |
| 2022.01.12. 13:30 | 10 |
| 2022.01.12. 13:45 | 10 |
| 2022.01.12. 14:00 | 10 |
| 2022.01.12. 14:15 | 10 |
| 2022.01.12. 14:30 | 10 |
| 2022.01.12. 14:45 | 10 |
| 2022.01.12. 15:00 | 10 |
| 2022.01.12. 15:15 | 10 |
| 2022.01.12. 15:30 | 10 |
| 2022.01.12. 15:45 | 10 |
| 2022.01.12. 16:00 | 10 |
| 2022.01.12. 16:15 | 10 |
| 2022.01.12. 16:30 | 10 |
| 2022.01.12. 16:45 | 10 |
| 2022.01.12. 17:00 | 10 |
| 2022.01.12. 17:15 | 10 |
| 2022.01.12. 17:30 | 10 |
| 2022.01.12. 17:45 | 10 |
| 2022.01.12. 18:00 | 10 |
| 2022.01.12. 18:15 | 10 |
| 2022.01.12. 18:30 | 10 |
| 2022.01.12. 18:45 | 10 |
| 2022.01.12. 19:00 | 10 |
| 2022.01.12. 19:15 | 10 |
| 2022.01.12. 19:30 | 10 |
| 2022.01.12. 19:45 | 10 |
| 2022.01.12. 20:00 | 10 |
| 2022.01.12. 20:15 | 10 |
| 2022.01.12. 20:30 | 10 |
| 2022.01.12. 20:45 | 10 |
| 2022.01.12. 21:00 | 10 |
| 2022.01.12. 21:15 | 10 |
| 2022.01.12. 21:30 | 10 |
| 2022.01.12. 21:45 | 10 |
| 2022.01.12. 22:00 | 10 |
| 2022.01.12. 22:15 | 10 |
| 2022.01.12. 22:30 | 10 |
| 2022.01.12. 22:45 | 10 |
| 2022.01.12. 23:00 | 10 |
| 2022.01.12. 23:15 | 10 |
| 2022.01.12. 23:30 | 10 |
| 2022.01.12. 23:45 | 10 |
| 2022.01.13. 00:00 | 10 |
| 2022.01.13. 00:15 | 10 |
| 2022.01.13. 00:30 | 10 |
| 2022.01.13. 00:45 | 10 |
| 2022.01.13. 01:00 | 10 |
| 2022.01.13. 01:15 | 10 |
| 2022.01.13. 01:30 | 10 |
| 2022.01.13. 01:45 | 10 |
| 2022.01.13. 02:00 | 10 |
| 2022.01.13. 02:15 | 10 |
| 2022.01.13. 02:30 | 10 |
| 2022.01.13. 02:45 | 10 |
| 2022.01.13. 03:00 | 10 |
| 2022.01.13. 03:15 | 10 |
| 2022.01.13. 03:30 | 10 |
| 2022.01.13. 03:45 | 10 |
| 2022.01.13. 04:00 | 10 |
| 2022.01.13. 04:15 | 10 |
| 2022.01.13. 04:30 | 10 |
| 2022.01.13. 04:45 | 10 |
| 2022.01.13. 05:00 | 10 |
| 2022.01.13. 05:15 | 10 |
| 2022.01.13. 05:30 | 10 |
| 2022.01.13. 05:45 | 10 |
| 2022.01.13. 06:00 | 10 |
| 2022.01.13. 06:15 | 10 |
| 2022.01.13. 06:30 | 10 |
| 2022.01.13. 06:45 | 10 |
| 2022.01.13. 07:00 | 10 |
| 2022.01.13. 07:15 | 10 |
| 2022.01.13. 07:30 | 10 |
| 2022.01.13. 07:45 | 10 |
| 2022.01.13. 08:00 | 10 |
| 2022.01.13. 08:15 | 10 |
| 2022.01.13. 08:30 | 10 |
| 2022.01.13. 08:45 | 10 |
| 2022.01.13. 09:00 | 10 |
| 2022.01.13. 09:15 | 10 |
| 2022.01.13. 09:30 | 10 |
| 2022.01.13. 09:45 | 10 |
| 2022.01.13. 10:00 | 10 |
| 2022.01.13. 10:15 | 10 |
| 2022.01.13. 10:30 | 10 |
| 2022.01.13. 10:45 | 10 |
| 2022.01.13. 11:00 | 10 |
| 2022.01.13. 11:15 | 10 |
| 2022.01.13. 11:30 | 10 |
| 2022.01.13. 11:45 | 10 |
| 2022.01.13. 12:00 | 10 |
| 2022.01.13. 12:15 | 10 |
| 2022.01.13. 12:30 | 10 |
| 2022.01.13. 12:45 | 10 |
| 2022.01.13. 13:00 | 10 |
| 2022.01.13. 13:15 | 10 |
| 2022.01.13. 13:30 | 10 |
| 2022.01.13. 13:45 | 10 |
| 2022.01.13. 14:00 | 10 |
| 2022.01.13. 14:15 | 10 |
| 2022.01.13. 14:30 | 10 |
| 2022.01.13. 14:45 | 10 |
| 2022.01.13. 15:00 | 10 |
| 2022.01.13. 15:15 | 10 |
| 2022.01.13. 15:30 | 10 |
| 2022.01.13. 15:45 | 10 |
| 2022.01.13. 16:00 | 10 |
| 2022.01.13. 16:15 | 10 |
| 2022.01.13. 16:30 | 10 |
| 2022.01.13. 16:45 | 10 |
| 2022.01.13. 17:00 | 10 |
| 2022.01.13. 17:15 | 10 |
| 2022.01.13. 17:30 | 10 |
| 2022.01.13. 17:45 | 10 |
| 2022.01.13. 18:00 | 10 |
| 2022.01.13. 18:15 | 10 |
| 2022.01.13. 18:30 | 10 |
| 2022.01.13. 18:45 | 10 |
| 2022.01.13. 19:00 | 10 |
| 2022.01.13. 19:15 | 10 |
| 2022.01.13. 19:30 | 10 |
| 2022.01.13. 19:45 | 10 |
| 2022.01.13. 20:00 | 10 |
| 2022.01.13. 20:15 | 10 |
| 2022.01.13. 20:30 | 10 |
| 2022.01.13. 20:45 | 10 |
| 2022.01.13. 21:00 | 10 |
| 2022.01.13. 21:15 | 10 |
| 2022.01.13. 21:30 | 10 |
| 2022.01.13. 21:45 | 10 |
| 2022.01.13. 22:00 | 10 |
| 2022.01.13. 22:15 | 10 |
| 2022.01.13. 22:30 | 10 |
| 2022.01.13. 22:45 | 10 |
| 2022.01.13. 23:00 | 10 |
| 2022.01.13. 23:15 | 10 |
| 2022.01.13. 23:30 | 10 |
| 2022.01.13. 23:45 | 10 |
| 2022.01.14. 00:00 | 10 |
| 2022.01.14. 00:15 | 10 |
| 2022.01.14. 00:30 | 10 |
| 2022.01.14. 00:45 | 10 |
| 2022.01.14. 01:00 | 10 |
| 2022.01.14. 01:15 | 10 |
| 2022.01.14. 01:30 | 10 |
| 2022.01.14. 01:45 | 10 |
| 2022.01.14. 02:00 | 10 |
| 2022.01.14. 02:15 | 10 |
| 2022.01.14. 02:30 | 10 |
| 2022.01.14. 02:45 | 10 |
| 2022.01.14. 03:00 | 10 |
| 2022.01.14. 03:15 | 10 |
| 2022.01.14. 03:30 | 10 |
| 2022.01.14. 03:45 | 10 |
| 2022.01.14. 04:00 | 10 |
| 2022.01.14. 04:15 | 10 |
| 2022.01.14. 04:30 | 10 |
| 2022.01.14. 04:45 | 10 |
| 2022.01.14. 05:00 | 10 |
| 2022.01.14. 05:15 | 10 |
| 2022.01.14. 05:30 | 10 |
| 2022.01.14. 05:45 | 10 |
| 2022.01.14. 06:00 | 10 |
| 2022.01.14. 06:15 | 10 |
| 2022.01.14. 06:30 | 10 |
| 2022.01.14. 06:45 | 10 |
| 2022.01.14. 07:00 | 10 |
| 2022.01.14. 07:15 | 10 |
| 2022.01.14. 07:30 | 10 |
| 2022.01.14. 07:45 | 10 |
| 2022.01.14. 08:00 | 10 |
| 2022.01.14. 08:15 | 10 |
| 2022.01.14. 08:30 | 10 |
| 2022.01.14. 08:45 | 10 |
| 2022.01.14. 09:00 | 10 |
| 2022.01.14. 09:15 | 10 |
| 2022.01.14. 09:30 | 10 |
| 2022.01.14. 09:45 | 10 |
| 2022.01.14. 10:00 | 10 |
| 2022.01.14. 10:15 | 10 |
| 2022.01.14. 10:30 | 10 |
| 2022.01.14. 10:45 | 10 |
| 2022.01.14. 11:00 | 10 |
| 2022.01.14. 11:15 | 10 |
| 2022.01.14. 11:30 | 10 |
| 2022.01.14. 11:45 | 10 |
| 2022.01.14. 12:00 | 10 |
| 2022.01.14. 12:15 | 10 |
| 2022.01.14. 12:30 | 10 |
| 2022.01.14. 12:45 | 10 |
| 2022.01.14. 13:00 | 10 |
| 2022.01.14. 13:15 | 10 |
| 2022.01.14. 13:30 | 10 |
| 2022.01.14. 13:45 | 10 |
| 2022.01.14. 14:00 | 10 |
| 2022.01.14. 14:15 | 10 |
| 2022.01.14. 14:30 | 10 |
| 2022.01.14. 14:45 | 10 |
| 2022.01.14. 15:00 | 10 |
| 2022.01.14. 15:15 | 10 |
| 2022.01.14. 15:30 | 10 |
| 2022.01.14. 15:45 | 10 |
| 2022.01.14. 16:00 | 10 |
| 2022.01.14. 16:15 | 10 |
| 2022.01.14. 16:30 | 10 |
| 2022.01.14. 16:45 | 10 |
| 2022.01.14. 17:00 | 10 |
| 2022.01.14. 17:15 | 10 |
| 2022.01.14. 17:30 | 10 |
| 2022.01.14. 17:45 | 10 |
| 2022.01.14. 18:00 | 10 |
| 2022.01.14. 18:15 | 10 |
| 2022.01.14. 18:30 | 10 |
| 2022.01.14. 18:45 | 10 |
| 2022.01.14. 19:00 | 10 |
| 2022.01.14. 19:15 | 10 |
| 2022.01.14. 19:30 | 10 |
| 2022.01.14. 19:45 | 10 |
| 2022.01.14. 20:00 | 10 |
| 2022.01.14. 20:15 | 10 |
| 2022.01.14. 20:30 | 10 |
| 2022.01.14. 20:45 | 10 |
| 2022.01.14. 21:00 | 10 |
| 2022.01.14. 21:15 | 10 |
| 2022.01.14. 21:30 | 10 |
| 2022.01.14. 21:45 | 10 |
| 2022.01.14. 22:00 | 10 |
| 2022.01.14. 22:15 | 10 |
| 2022.01.14. 22:30 | 10 |
| 2022.01.14. 22:45 | 10 |
| 2022.01.14. 23:00 | 10 |
| 2022.01.14. 23:15 | 10 |
| 2022.01.14. 23:30 | 10 |
| 2022.01.14. 23:45 | 10 |
| 2022.01.15. 00:00 | 12 |
| 2022.01.15. 00:15 | 12 |
| 2022.01.15. 00:30 | 12 |
| 2022.01.15. 00:45 | 12 |
| 2022.01.15. 01:00 | 12 |
| 2022.01.15. 01:15 | 12 |
| 2022.01.15. 01:30 | 12 |
| 2022.01.15. 01:45 | 12 |
| 2022.01.15. 02:00 | 12 |
| 2022.01.15. 02:15 | 12 |
| 2022.01.15. 02:30 | 12 |
| 2022.01.15. 02:45 | 12 |
| 2022.01.15. 03:00 | 12 |
| 2022.01.15. 03:15 | 12 |
| 2022.01.15. 03:30 | 12 |
| 2022.01.15. 03:45 | 12 |
| 2022.01.15. 04:00 | 12 |
| 2022.01.15. 04:15 | 12 |
| 2022.01.15. 04:30 | 12 |
| 2022.01.15. 04:45 | 12 |
| 2022.01.15. 05:00 | 12 |
| 2022.01.15. 05:15 | 12 |
| 2022.01.15. 05:30 | 12 |
| 2022.01.15. 05:45 | 12 |
| 2022.01.15. 06:00 | 12 |
| 2022.01.15. 06:15 | 12 |
| 2022.01.15. 06:30 | 12 |
| 2022.01.15. 06:45 | 12 |
| 2022.01.15. 07:00 | 12 |
| 2022.01.15. 07:15 | 12 |
| 2022.01.15. 07:30 | 12 |
| 2022.01.15. 07:45 | 12 |
| 2022.01.15. 08:00 | 12 |
| 2022.01.15. 08:15 | 12 |
| 2022.01.15. 08:30 | 12 |
| 2022.01.15. 08:45 | 12 |
| 2022.01.15. 09:00 | 12 |
| 2022.01.15. 09:15 | 12 |
| 2022.01.15. 09:30 | 12 |
| 2022.01.15. 09:45 | 12 |
| 2022.01.15. 10:00 | 12 |
| 2022.01.15. 10:15 | 12 |
| 2022.01.15. 10:30 | 12 |
| 2022.01.15. 10:45 | 12 |
| 2022.01.15. 11:00 | 12 |
| 2022.01.15. 11:15 | 12 |
| 2022.01.15. 11:30 | 12 |
| 2022.01.15. 11:45 | 12 |
| 2022.01.15. 12:00 | 12 |
| 2022.01.15. 12:15 | 12 |
| 2022.01.15. 12:30 | 12 |
| 2022.01.15. 12:45 | 12 |
| 2022.01.15. 13:00 | 12 |
| 2022.01.15. 13:15 | 12 |
| 2022.01.15. 13:30 | 12 |
| 2022.01.15. 13:45 | 12 |
| 2022.01.15. 14:00 | 12 |
| 2022.01.15. 14:15 | 12 |
| 2022.01.15. 14:30 | 12 |
| 2022.01.15. 14:45 | 12 |
| 2022.01.15. 15:00 | 12 |
| 2022.01.15. 15:15 | 12 |
| 2022.01.15. 15:30 | 12 |
| 2022.01.15. 15:45 | 12 |
| 2022.01.15. 16:00 | 12 |
| 2022.01.15. 16:15 | 12 |
| 2022.01.15. 16:30 | 12 |
| 2022.01.15. 16:45 | 12 |
| 2022.01.15. 17:00 | 12 |
| 2022.01.15. 17:15 | 12 |
| 2022.01.15. 17:30 | 12 |
| 2022.01.15. 17:45 | 12 |
| 2022.01.15. 18:00 | 12 |
| 2022.01.15. 18:15 | 12 |
| 2022.01.15. 18:30 | 12 |
| 2022.01.15. 18:45 | 12 |
| 2022.01.15. 19:00 | 12 |
| 2022.01.15. 19:15 | 12 |
| 2022.01.15. 19:30 | 12 |
| 2022.01.15. 19:45 | 12 |
| 2022.01.15. 20:00 | 12 |
| 2022.01.15. 20:15 | 12 |
| 2022.01.15. 20:30 | 12 |
| 2022.01.15. 20:45 | 12 |
| 2022.01.15. 21:00 | 12 |
| 2022.01.15. 21:15 | 12 |
| 2022.01.15. 21:30 | 12 |
| 2022.01.15. 21:45 | 12 |
| 2022.01.15. 22:00 | 12 |
| 2022.01.15. 22:15 | 12 |
| 2022.01.15. 22:30 | 12 |
| 2022.01.15. 22:45 | 12 |
| 2022.01.15. 23:00 | 12 |
| 2022.01.15. 23:15 | 12 |
| 2022.01.15. 23:30 | 12 |
| 2022.01.15. 23:45 | 12 |
| 2022.01.16. 00:00 | 12 |
| 2022.01.16. 00:15 | 12 |
| 2022.01.16. 00:30 | 12 |
| 2022.01.16. 00:45 | 12 |
| 2022.01.16. 01:00 | 12 |
| 2022.01.16. 01:15 | 12 |
| 2022.01.16. 01:30 | 12 |
| 2022.01.16. 01:45 | 12 |
| 2022.01.16. 02:00 | 12 |
| 2022.01.16. 02:15 | 12 |
| 2022.01.16. 02:30 | 12 |
| 2022.01.16. 02:45 | 12 |
| 2022.01.16. 03:00 | 12 |
| 2022.01.16. 03:15 | 12 |
| 2022.01.16. 03:30 | 12 |
| 2022.01.16. 03:45 | 12 |
| 2022.01.16. 04:00 | 12 |
| 2022.01.16. 04:15 | 12 |
| 2022.01.16. 04:30 | 12 |
| 2022.01.16. 04:45 | 12 |
| 2022.01.16. 05:00 | 12 |
| 2022.01.16. 05:15 | 12 |
| 2022.01.16. 05:30 | 12 |
| 2022.01.16. 05:45 | 12 |
| 2022.01.16. 06:00 | 12 |
| 2022.01.16. 06:15 | 12 |
| 2022.01.16. 06:30 | 12 |
| 2022.01.16. 06:45 | 12 |
| 2022.01.16. 07:00 | 12 |
| 2022.01.16. 07:15 | 12 |
| 2022.01.16. 07:30 | 12 |
| 2022.01.16. 07:45 | 12 |
| 2022.01.16. 08:00 | 12 |
| 2022.01.16. 08:15 | 12 |
| 2022.01.16. 08:30 | 12 |
| 2022.01.16. 08:45 | 12 |
| 2022.01.16. 09:00 | 12 |
| 2022.01.16. 09:15 | 12 |
| 2022.01.16. 09:30 | 12 |
| 2022.01.16. 09:45 | 12 |
| 2022.01.16. 10:00 | 12 |
| 2022.01.16. 10:15 | 12 |
| 2022.01.16. 10:30 | 12 |
| 2022.01.16. 10:45 | 12 |
| 2022.01.16. 11:00 | 12 |
| 2022.01.16. 11:15 | 12 |
| 2022.01.16. 11:30 | 12 |
| 2022.01.16. 11:45 | 12 |
| 2022.01.16. 12:00 | 12 |
| 2022.01.16. 12:15 | 12 |
| 2022.01.16. 12:30 | 12 |
| 2022.01.16. 12:45 | 12 |
| 2022.01.16. 13:00 | 12 |
| 2022.01.16. 13:15 | 12 |
| 2022.01.16. 13:30 | 12 |
| 2022.01.16. 13:45 | 12 |
| 2022.01.16. 14:00 | 12 |
| 2022.01.16. 14:15 | 12 |
| 2022.01.16. 14:30 | 12 |
| 2022.01.16. 14:45 | 12 |
| 2022.01.16. 15:00 | 12 |
| 2022.01.16. 15:15 | 12 |
| 2022.01.16. 15:30 | 12 |
| 2022.01.16. 15:45 | 12 |
| 2022.01.16. 16:00 | 12 |
| 2022.01.16. 16:15 | 12 |
| 2022.01.16. 16:30 | 12 |
| 2022.01.16. 16:45 | 12 |
| 2022.01.16. 17:00 | 12 |
| 2022.01.16. 17:15 | 12 |
| 2022.01.16. 17:30 | 12 |
| 2022.01.16. 17:45 | 12 |
| 2022.01.16. 18:00 | 12 |
| 2022.01.16. 18:15 | 12 |
| 2022.01.16. 18:30 | 12 |
| 2022.01.16. 18:45 | 12 |
| 2022.01.16. 19:00 | 12 |
| 2022.01.16. 19:15 | 12 |
| 2022.01.16. 19:30 | 12 |
| 2022.01.16. 19:45 | 12 |
| 2022.01.16. 20:00 | 12 |
| 2022.01.16. 20:15 | 12 |
| 2022.01.16. 20:30 | 12 |
| 2022.01.16. 20:45 | 12 |
| 2022.01.16. 21:00 | 12 |
| 2022.01.16. 21:15 | 12 |
| 2022.01.16. 21:30 | 12 |
| 2022.01.16. 21:45 | 12 |
| 2022.01.16. 22:00 | 12 |
| 2022.01.16. 22:15 | 12 |
| 2022.01.16. 22:30 | 12 |
| 2022.01.16. 22:45 | 12 |
| 2022.01.16. 23:00 | 12 |
| 2022.01.16. 23:15 | 12 |
| 2022.01.16. 23:30 | 12 |
| 2022.01.16. 23:45 | 12 |
| 2022.01.17. 00:00 | 12 |
| 2022.01.17. 00:15 | 12 |
| 2022.01.17. 00:30 | 12 |
| 2022.01.17. 00:45 | 12 |
| 2022.01.17. 01:00 | 12 |
| 2022.01.17. 01:15 | 12 |
| 2022.01.17. 01:30 | 12 |
| 2022.01.17. 01:45 | 12 |
| 2022.01.17. 02:00 | 12 |
| 2022.01.17. 02:15 | 12 |
| 2022.01.17. 02:30 | 12 |
| 2022.01.17. 02:45 | 12 |
| 2022.01.17. 03:00 | 12 |
| 2022.01.17. 03:15 | 12 |
| 2022.01.17. 03:30 | 12 |
| 2022.01.17. 03:45 | 12 |
| 2022.01.17. 04:00 | 12 |
| 2022.01.17. 04:15 | 12 |
| 2022.01.17. 04:30 | 12 |
| 2022.01.17. 04:45 | 12 |
| 2022.01.17. 05:00 | 12 |
| 2022.01.17. 05:15 | 12 |
| 2022.01.17. 05:30 | 12 |
| 2022.01.17. 05:45 | 12 |
| 2022.01.17. 06:00 | 12 |
| 2022.01.17. 06:15 | 12 |
| 2022.01.17. 06:30 | 12 |
| 2022.01.17. 06:45 | 12 |
| 2022.01.17. 07:00 | 12 |
| 2022.01.17. 07:15 | 12 |
| 2022.01.17. 07:30 | 12 |
| 2022.01.17. 07:45 | 12 |
| 2022.01.17. 08:00 | 12 |
| 2022.01.17. 08:15 | 12 |
| 2022.01.17. 08:30 | 12 |
| 2022.01.17. 08:45 | 12 |
| 2022.01.17. 09:00 | 12 |
| 2022.01.17. 09:15 | 12 |
| 2022.01.17. 09:30 | 12 |
| 2022.01.17. 09:45 | 12 |
| 2022.01.17. 10:00 | 12 |
| 2022.01.17. 10:15 | 12 |
| 2022.01.17. 10:30 | 12 |
| 2022.01.17. 10:45 | 12 |
| 2022.01.17. 11:00 | 12 |
| 2022.01.17. 11:15 | 12 |
| 2022.01.17. 11:30 | 12 |
| 2022.01.17. 11:45 | 12 |
| 2022.01.17. 12:00 | 12 |
| 2022.01.17. 12:15 | 12 |
| 2022.01.17. 12:30 | 12 |
| 2022.01.17. 12:45 | 12 |
| 2022.01.17. 13:00 | 12 |
| 2022.01.17. 13:15 | 12 |
| 2022.01.17. 13:30 | 12 |
| 2022.01.17. 13:45 | 12 |
| 2022.01.17. 14:00 | 12 |
| 2022.01.17. 14:15 | 12 |
| 2022.01.17. 14:30 | 12 |
| 2022.01.17. 14:45 | 12 |
| 2022.01.17. 15:00 | 12 |
| 2022.01.17. 15:15 | 12 |
| 2022.01.17. 15:30 | 12 |
| 2022.01.17. 15:45 | 12 |
| 2022.01.17. 16:00 | 12 |
| 2022.01.17. 16:15 | 12 |
| 2022.01.17. 16:30 | 12 |
| 2022.01.17. 16:45 | 12 |
| 2022.01.17. 17:00 | 12 |
| 2022.01.17. 17:15 | 12 |
| 2022.01.17. 17:30 | 12 |
| 2022.01.17. 17:45 | 12 |
| 2022.01.17. 18:00 | 12 |
| 2022.01.17. 18:15 | 12 |
| 2022.01.17. 18:30 | 12 |
| 2022.01.17. 18:45 | 12 |
| 2022.01.17. 19:00 | 12 |
| 2022.01.17. 19:15 | 12 |
| 2022.01.17. 19:30 | 12 |
| 2022.01.17. 19:45 | 12 |
| 2022.01.17. 20:00 | 12 |
| 2022.01.17. 20:15 | 12 |
| 2022.01.17. 20:30 | 12 |
| 2022.01.17. 20:45 | 12 |
| 2022.01.17. 21:00 | 12 |
| 2022.01.17. 21:15 | 12 |
| 2022.01.17. 21:30 | 12 |
| 2022.01.17. 21:45 | 12 |
| 2022.01.17. 22:00 | 12 |
| 2022.01.17. 22:15 | 12 |
| 2022.01.17. 22:30 | 12 |
| 2022.01.17. 22:45 | 12 |
| 2022.01.17. 23:00 | 12 |
| 2022.01.17. 23:15 | 12 |
| 2022.01.17. 23:30 | 12 |
| 2022.01.17. 23:45 | 12 |
| 2022.01.18. 00:00 | 12 |
| 2022.01.18. 00:15 | 12 |
| 2022.01.18. 00:30 | 12 |
| 2022.01.18. 00:45 | 12 |
| 2022.01.18. 01:00 | 12 |
| 2022.01.18. 01:15 | 12 |
| 2022.01.18. 01:30 | 12 |
| 2022.01.18. 01:45 | 12 |
| 2022.01.18. 02:00 | 12 |
| 2022.01.18. 02:15 | 12 |
| 2022.01.18. 02:30 | 12 |
| 2022.01.18. 02:45 | 12 |
| 2022.01.18. 03:00 | 12 |
| 2022.01.18. 03:15 | 12 |
| 2022.01.18. 03:30 | 12 |
| 2022.01.18. 03:45 | 12 |
| 2022.01.18. 04:00 | 12 |
| 2022.01.18. 04:15 | 12 |
| 2022.01.18. 04:30 | 12 |
| 2022.01.18. 04:45 | 12 |
| 2022.01.18. 05:00 | 12 |
| 2022.01.18. 05:15 | 12 |
| 2022.01.18. 05:30 | 12 |
| 2022.01.18. 05:45 | 12 |
| 2022.01.18. 06:00 | 12 |
| 2022.01.18. 06:15 | 12 |
| 2022.01.18. 06:30 | 12 |
| 2022.01.18. 06:45 | 12 |
| 2022.01.18. 07:00 | 12 |
| 2022.01.18. 07:15 | 12 |
| 2022.01.18. 07:30 | 12 |
| 2022.01.18. 07:45 | 12 |
| 2022.01.18. 08:00 | 12 |
| 2022.01.18. 08:15 | 12 |
| 2022.01.18. 08:30 | 12 |
| 2022.01.18. 08:45 | 12 |
| 2022.01.18. 09:00 | 12 |
| 2022.01.18. 09:15 | 12 |
| 2022.01.18. 09:30 | 12 |
| 2022.01.18. 09:45 | 12 |
| 2022.01.18. 10:00 | 12 |
| 2022.01.18. 10:15 | 12 |
| 2022.01.18. 10:30 | 12 |
| 2022.01.18. 10:45 | 12 |
| 2022.01.18. 11:00 | 12 |
| 2022.01.18. 11:15 | 12 |
| 2022.01.18. 11:30 | 12 |
| 2022.01.18. 11:45 | 12 |
| 2022.01.18. 12:00 | 12 |
| 2022.01.18. 12:15 | 12 |
| 2022.01.18. 12:30 | 12 |
| 2022.01.18. 12:45 | 12 |
| 2022.01.18. 13:00 | 12 |
| 2022.01.18. 13:15 | 12 |
| 2022.01.18. 13:30 | 12 |
| 2022.01.18. 13:45 | 12 |
| 2022.01.18. 14:00 | 12 |
| 2022.01.18. 14:15 | 12 |
| 2022.01.18. 14:30 | 12 |
| 2022.01.18. 14:45 | 12 |
| 2022.01.18. 15:00 | 12 |
| 2022.01.18. 15:15 | 12 |
| 2022.01.18. 15:30 | 12 |
| 2022.01.18. 15:45 | 12 |
| 2022.01.18. 16:00 | 12 |
| 2022.01.18. 16:15 | 12 |
| 2022.01.18. 16:30 | 12 |
| 2022.01.18. 16:45 | 12 |
| 2022.01.18. 17:00 | 12 |
| 2022.01.18. 17:15 | 12 |
| 2022.01.18. 17:30 | 12 |
| 2022.01.18. 17:45 | 12 |
| 2022.01.18. 18:00 | 12 |
| 2022.01.18. 18:15 | 12 |
| 2022.01.18. 18:30 | 12 |
| 2022.01.18. 18:45 | 12 |
| 2022.01.18. 19:00 | 12 |
| 2022.01.18. 19:15 | 12 |
| 2022.01.18. 19:30 | 12 |
| 2022.01.18. 19:45 | 12 |
| 2022.01.18. 20:00 | 12 |
| 2022.01.18. 20:15 | 12 |
| 2022.01.18. 20:30 | 12 |
| 2022.01.18. 20:45 | 12 |
| 2022.01.18. 21:00 | 12 |
| 2022.01.18. 21:15 | 12 |
| 2022.01.18. 21:30 | 12 |
| 2022.01.18. 21:45 | 12 |
| 2022.01.18. 22:00 | 12 |
| 2022.01.18. 22:15 | 12 |
| 2022.01.18. 22:30 | 12 |
| 2022.01.18. 22:45 | 12 |
| 2022.01.18. 23:00 | 12 |
| 2022.01.18. 23:15 | 12 |
| 2022.01.18. 23:30 | 12 |
| 2022.01.18. 23:45 | 12 |
| 2022.01.19. 00:00 | 12 |
| 2022.01.19. 00:15 | 12 |
| 2022.01.19. 00:30 | 12 |
| 2022.01.19. 00:45 | 12 |
| 2022.01.19. 01:00 | 12 |
| 2022.01.19. 01:15 | 12 |
| 2022.01.19. 01:30 | 12 |
| 2022.01.19. 01:45 | 12 |
| 2022.01.19. 02:00 | 12 |
| 2022.01.19. 02:15 | 12 |
| 2022.01.19. 02:30 | 12 |
| 2022.01.19. 02:45 | 12 |
| 2022.01.19. 03:00 | 12 |
| 2022.01.19. 03:15 | 12 |
| 2022.01.19. 03:30 | 12 |
| 2022.01.19. 03:45 | 12 |
| 2022.01.19. 04:00 | 12 |
| 2022.01.19. 04:15 | 12 |
| 2022.01.19. 04:30 | 12 |
| 2022.01.19. 04:45 | 12 |
| 2022.01.19. 05:00 | 12 |
| 2022.01.19. 05:15 | 12 |
| 2022.01.19. 05:30 | 12 |
| 2022.01.19. 05:45 | 12 |
| 2022.01.19. 06:00 | 12 |
| 2022.01.19. 06:15 | 12 |
| 2022.01.19. 06:30 | 12 |
| 2022.01.19. 06:45 | 12 |
| 2022.01.19. 07:00 | 12 |
| 2022.01.19. 07:15 | 12 |
| 2022.01.19. 07:30 | 12 |
| 2022.01.19. 07:45 | 12 |
| 2022.01.19. 08:00 | 12 |
| 2022.01.19. 08:15 | 12 |
| 2022.01.19. 08:30 | 12 |
| 2022.01.19. 08:45 | 12 |
| 2022.01.19. 09:00 | 12 |
| 2022.01.19. 09:15 | 12 |
| 2022.01.19. 09:30 | 12 |
| 2022.01.19. 09:45 | 12 |
| 2022.01.19. 10:00 | 12 |
| 2022.01.19. 10:15 | 12 |
| 2022.01.19. 10:30 | 12 |
| 2022.01.19. 10:45 | 12 |
| 2022.01.19. 11:00 | 12 |
| 2022.01.19. 11:15 | 12 |
| 2022.01.19. 11:30 | 12 |
| 2022.01.19. 11:45 | 12 |
| 2022.01.19. 12:00 | 12 |
| 2022.01.19. 12:15 | 12 |
| 2022.01.19. 12:30 | 12 |
| 2022.01.19. 12:45 | 12 |
| 2022.01.19. 13:00 | 12 |
| 2022.01.19. 13:15 | 12 |
| 2022.01.19. 13:30 | 12 |
| 2022.01.19. 13:45 | 12 |
| 2022.01.19. 14:00 | 12 |
| 2022.01.19. 14:15 | 12 |
| 2022.01.19. 14:30 | 12 |
| 2022.01.19. 14:45 | 12 |
| 2022.01.19. 15:00 | 12 |
| 2022.01.19. 15:15 | 12 |
| 2022.01.19. 15:30 | 12 |
| 2022.01.19. 15:45 | 12 |
| 2022.01.19. 16:00 | 12 |
| 2022.01.19. 16:15 | 12 |
| 2022.01.19. 16:30 | 12 |
| 2022.01.19. 16:45 | 12 |
| 2022.01.19. 17:00 | 12 |
| 2022.01.19. 17:15 | 12 |
| 2022.01.19. 17:30 | 12 |
| 2022.01.19. 17:45 | 12 |
| 2022.01.19. 18:00 | 12 |
| 2022.01.19. 18:15 | 12 |
| 2022.01.19. 18:30 | 12 |
| 2022.01.19. 18:45 | 12 |
| 2022.01.19. 19:00 | 12 |
| 2022.01.19. 19:15 | 12 |
| 2022.01.19. 19:30 | 12 |
| 2022.01.19. 19:45 | 12 |
| 2022.01.19. 20:00 | 12 |
| 2022.01.19. 20:15 | 12 |
| 2022.01.19. 20:30 | 12 |
| 2022.01.19. 20:45 | 12 |
| 2022.01.19. 21:00 | 12 |
| 2022.01.19. 21:15 | 12 |
| 2022.01.19. 21:30 | 12 |
| 2022.01.19. 21:45 | 12 |
| 2022.01.19. 22:00 | 12 |
| 2022.01.19. 22:15 | 12 |
| 2022.01.19. 22:30 | 12 |
| 2022.01.19. 22:45 | 12 |
| 2022.01.19. 23:00 | 12 |
| 2022.01.19. 23:15 | 12 |
| 2022.01.19. 23:30 | 12 |
| 2022.01.19. 23:45 | 12 |
| 2022.01.20. 00:00 | 12 |
| 2022.01.20. 00:15 | 12 |
| 2022.01.20. 00:30 | 12 |
| 2022.01.20. 00:45 | 12 |
| 2022.01.20. 01:00 | 12 |
| 2022.01.20. 01:15 | 12 |
| 2022.01.20. 01:30 | 12 |
| 2022.01.20. 01:45 | 12 |
| 2022.01.20. 02:00 | 12 |
| 2022.01.20. 02:15 | 12 |
| 2022.01.20. 02:30 | 12 |
| 2022.01.20. 02:45 | 12 |
| 2022.01.20. 03:00 | 12 |
| 2022.01.20. 03:15 | 12 |
| 2022.01.20. 03:30 | 12 |
| 2022.01.20. 03:45 | 12 |
| 2022.01.20. 04:00 | 12 |
| 2022.01.20. 04:15 | 12 |
| 2022.01.20. 04:30 | 12 |
| 2022.01.20. 04:45 | 12 |
| 2022.01.20. 05:00 | 12 |
| 2022.01.20. 05:15 | 12 |
| 2022.01.20. 05:30 | 12 |
| 2022.01.20. 05:45 | 12 |
| 2022.01.20. 06:00 | 12 |
| 2022.01.20. 06:15 | 12 |
| 2022.01.20. 06:30 | 12 |
| 2022.01.20. 06:45 | 12 |
| 2022.01.20. 07:00 | 12 |
| 2022.01.20. 07:15 | 12 |
| 2022.01.20. 07:30 | 12 |
| 2022.01.20. 07:45 | 12 |
| 2022.01.20. 08:00 | 12 |
| 2022.01.20. 08:15 | 12 |
| 2022.01.20. 08:30 | 12 |
| 2022.01.20. 08:45 | 12 |
| 2022.01.20. 09:00 | 12 |
| 2022.01.20. 09:15 | 12 |
| 2022.01.20. 09:30 | 12 |
| 2022.01.20. 09:45 | 12 |
| 2022.01.20. 10:00 | 12 |
| 2022.01.20. 10:15 | 12 |
| 2022.01.20. 10:30 | 12 |
| 2022.01.20. 10:45 | 12 |
| 2022.01.20. 11:00 | 12 |
| 2022.01.20. 11:15 | 12 |
| 2022.01.20. 11:30 | 12 |
| 2022.01.20. 11:45 | 12 |
| 2022.01.20. 12:00 | 12 |
| 2022.01.20. 12:15 | 12 |
| 2022.01.20. 12:30 | 12 |
| 2022.01.20. 12:45 | 12 |
| 2022.01.20. 13:00 | 12 |
| 2022.01.20. 13:15 | 12 |
| 2022.01.20. 13:30 | 12 |
| 2022.01.20. 13:45 | 12 |
| 2022.01.20. 14:00 | 12 |
| 2022.01.20. 14:15 | 12 |
| 2022.01.20. 14:30 | 12 |
| 2022.01.20. 14:45 | 12 |
| 2022.01.20. 15:00 | 12 |
| 2022.01.20. 15:15 | 12 |
| 2022.01.20. 15:30 | 12 |
| 2022.01.20. 15:45 | 12 |
| 2022.01.20. 16:00 | 12 |
| 2022.01.20. 16:15 | 12 |
| 2022.01.20. 16:30 | 12 |
| 2022.01.20. 16:45 | 12 |
| 2022.01.20. 17:00 | 12 |
| 2022.01.20. 17:15 | 12 |
| 2022.01.20. 17:30 | 12 |
| 2022.01.20. 17:45 | 12 |
| 2022.01.20. 18:00 | 12 |
| 2022.01.20. 18:15 | 12 |
| 2022.01.20. 18:30 | 12 |
| 2022.01.20. 18:45 | 12 |
| 2022.01.20. 19:00 | 12 |
| 2022.01.20. 19:15 | 12 |
| 2022.01.20. 19:30 | 12 |
| 2022.01.20. 19:45 | 12 |
| 2022.01.20. 20:00 | 12 |
| 2022.01.20. 20:15 | 12 |
| 2022.01.20. 20:30 | 12 |
| 2022.01.20. 20:45 | 12 |
| 2022.01.20. 21:00 | 12 |
| 2022.01.20. 21:15 | 12 |
| 2022.01.20. 21:30 | 12 |
| 2022.01.20. 21:45 | 12 |
| 2022.01.20. 22:00 | 12 |
| 2022.01.20. 22:15 | 12 |
| 2022.01.20. 22:30 | 12 |
| 2022.01.20. 22:45 | 12 |
| 2022.01.20. 23:00 | 12 |
| 2022.01.20. 23:15 | 12 |
| 2022.01.20. 23:30 | 12 |
| 2022.01.20. 23:45 | 12 |
| 2022.01.21. 00:00 | 12 |
| 2022.01.21. 00:15 | 12 |
| 2022.01.21. 00:30 | 12 |
| 2022.01.21. 00:45 | 12 |
| 2022.01.21. 01:00 | 12 |
| 2022.01.21. 01:15 | 12 |
| 2022.01.21. 01:30 | 12 |
| 2022.01.21. 01:45 | 12 |
| 2022.01.21. 02:00 | 12 |
| 2022.01.21. 02:15 | 12 |
| 2022.01.21. 02:30 | 12 |
| 2022.01.21. 02:45 | 12 |
| 2022.01.21. 03:00 | 12 |
| 2022.01.21. 03:15 | 12 |
| 2022.01.21. 03:30 | 12 |
| 2022.01.21. 03:45 | 12 |
| 2022.01.21. 04:00 | 12 |
| 2022.01.21. 04:15 | 12 |
| 2022.01.21. 04:30 | 12 |
| 2022.01.21. 04:45 | 12 |
| 2022.01.21. 05:00 | 12 |
| 2022.01.21. 05:15 | 12 |
| 2022.01.21. 05:30 | 12 |
| 2022.01.21. 05:45 | 12 |
| 2022.01.21. 06:00 | 12 |
| 2022.01.21. 06:15 | 12 |
| 2022.01.21. 06:30 | 12 |
| 2022.01.21. 06:45 | 12 |
| 2022.01.21. 07:00 | 12 |
| 2022.01.21. 07:15 | 12 |
| 2022.01.21. 07:30 | 12 |
| 2022.01.21. 07:45 | 12 |
| 2022.01.21. 08:00 | 12 |
| 2022.01.21. 08:15 | 12 |
| 2022.01.21. 08:30 | 12 |
| 2022.01.21. 08:45 | 12 |
| 2022.01.21. 09:00 | 12 |
| 2022.01.21. 09:15 | 12 |
| 2022.01.21. 09:30 | 12 |
| 2022.01.21. 09:45 | 12 |
| 2022.01.21. 10:00 | 12 |
| 2022.01.21. 10:15 | 12 |
| 2022.01.21. 10:30 | 12 |
| 2022.01.21. 10:45 | 12 |
| 2022.01.21. 11:00 | 12 |
| 2022.01.21. 11:15 | 12 |
| 2022.01.21. 11:30 | 12 |
| 2022.01.21. 11:45 | 12 |
| 2022.01.21. 12:00 | 12 |
| 2022.01.21. 12:15 | 12 |
| 2022.01.21. 12:30 | 12 |
| 2022.01.21. 12:45 | 12 |
| 2022.01.21. 13:00 | 12 |
| 2022.01.21. 13:15 | 12 |
| 2022.01.21. 13:30 | 12 |
| 2022.01.21. 13:45 | 12 |
| 2022.01.21. 14:00 | 12 |
| 2022.01.21. 14:15 | 12 |
| 2022.01.21. 14:30 | 12 |
| 2022.01.21. 14:45 | 12 |
| 2022.01.21. 15:00 | 12 |
| 2022.01.21. 15:15 | 12 |
| 2022.01.21. 15:30 | 12 |
| 2022.01.21. 15:45 | 12 |
| 2022.01.21. 16:00 | 12 |
| 2022.01.21. 16:15 | 12 |
| 2022.01.21. 16:30 | 12 |
| 2022.01.21. 16:45 | 12 |
| 2022.01.21. 17:00 | 12 |
| 2022.01.21. 17:15 | 12 |
| 2022.01.21. 17:30 | 12 |
| 2022.01.21. 17:45 | 12 |
| 2022.01.21. 18:00 | 12 |
| 2022.01.21. 18:15 | 12 |
| 2022.01.21. 18:30 | 12 |
| 2022.01.21. 18:45 | 12 |
| 2022.01.21. 19:00 | 12 |
| 2022.01.21. 19:15 | 12 |
| 2022.01.21. 19:30 | 12 |
| 2022.01.21. 19:45 | 12 |
| 2022.01.21. 20:00 | 12 |
| 2022.01.21. 20:15 | 12 |
| 2022.01.21. 20:30 | 12 |
| 2022.01.21. 20:45 | 12 |
| 2022.01.21. 21:00 | 12 |
| 2022.01.21. 21:15 | 12 |
| 2022.01.21. 21:30 | 12 |
| 2022.01.21. 21:45 | 12 |
| 2022.01.21. 22:00 | 12 |
| 2022.01.21. 22:15 | 12 |
| 2022.01.21. 22:30 | 12 |
| 2022.01.21. 22:45 | 12 |
| 2022.01.21. 23:00 | 12 |
| 2022.01.21. 23:15 | 12 |
| 2022.01.21. 23:30 | 12 |
| 2022.01.21. 23:45 | 12 |
| 2022.01.22. 00:00 | 12 |
| 2022.01.22. 00:15 | 12 |
| 2022.01.22. 00:30 | 12 |
| 2022.01.22. 00:45 | 12 |
| 2022.01.22. 01:00 | 12 |
| 2022.01.22. 01:15 | 12 |
| 2022.01.22. 01:30 | 12 |
| 2022.01.22. 01:45 | 12 |
| 2022.01.22. 02:00 | 12 |
| 2022.01.22. 02:15 | 12 |
| 2022.01.22. 02:30 | 12 |
| 2022.01.22. 02:45 | 12 |
| 2022.01.22. 03:00 | 12 |
| 2022.01.22. 03:15 | 12 |
| 2022.01.22. 03:30 | 12 |
| 2022.01.22. 03:45 | 12 |
| 2022.01.22. 04:00 | 12 |
| 2022.01.22. 04:15 | 12 |
| 2022.01.22. 04:30 | 12 |
| 2022.01.22. 04:45 | 12 |
| 2022.01.22. 05:00 | 12 |
| 2022.01.22. 05:15 | 12 |
| 2022.01.22. 05:30 | 12 |
| 2022.01.22. 05:45 | 12 |
| 2022.01.22. 06:00 | 12 |
| 2022.01.22. 06:15 | 12 |
| 2022.01.22. 06:30 | 12 |
| 2022.01.22. 06:45 | 12 |
| 2022.01.22. 07:00 | 12 |
| 2022.01.22. 07:15 | 12 |
| 2022.01.22. 07:30 | 12 |
| 2022.01.22. 07:45 | 12 |
| 2022.01.22. 08:00 | 12 |
| 2022.01.22. 08:15 | 12 |
| 2022.01.22. 08:30 | 12 |
| 2022.01.22. 08:45 | 12 |
| 2022.01.22. 09:00 | 12 |
| 2022.01.22. 09:15 | 12 |
| 2022.01.22. 09:30 | 12 |
| 2022.01.22. 09:45 | 12 |
| 2022.01.22. 10:00 | 12 |
| 2022.01.22. 10:15 | 12 |
| 2022.01.22. 10:30 | 12 |
| 2022.01.22. 10:45 | 12 |
| 2022.01.22. 11:00 | 12 |
| 2022.01.22. 11:15 | 12 |
| 2022.01.22. 11:30 | 12 |
| 2022.01.22. 11:45 | 12 |
| 2022.01.22. 12:00 | 12 |
| 2022.01.22. 12:15 | 12 |
| 2022.01.22. 12:30 | 12 |
| 2022.01.22. 12:45 | 12 |
| 2022.01.22. 13:00 | 12 |
| 2022.01.22. 13:15 | 12 |
| 2022.01.22. 13:30 | 12 |
| 2022.01.22. 13:45 | 12 |
| 2022.01.22. 14:00 | 12 |
| 2022.01.22. 14:15 | 12 |
| 2022.01.22. 14:30 | 12 |
| 2022.01.22. 14:45 | 12 |
| 2022.01.22. 15:00 | 12 |
| 2022.01.22. 15:15 | 12 |
| 2022.01.22. 15:30 | 12 |
| 2022.01.22. 15:45 | 12 |
| 2022.01.22. 16:00 | 12 |
| 2022.01.22. 16:15 | 12 |
| 2022.01.22. 16:30 | 12 |
| 2022.01.22. 16:45 | 12 |
| 2022.01.22. 17:00 | 12 |
| 2022.01.22. 17:15 | 12 |
| 2022.01.22. 17:30 | 12 |
| 2022.01.22. 17:45 | 12 |
| 2022.01.22. 18:00 | 12 |
| 2022.01.22. 18:15 | 12 |
| 2022.01.22. 18:30 | 12 |
| 2022.01.22. 18:45 | 12 |
| 2022.01.22. 19:00 | 12 |
| 2022.01.22. 19:15 | 12 |
| 2022.01.22. 19:30 | 12 |
| 2022.01.22. 19:45 | 12 |
| 2022.01.22. 20:00 | 12 |
| 2022.01.22. 20:15 | 12 |
| 2022.01.22. 20:30 | 12 |
| 2022.01.22. 20:45 | 12 |
| 2022.01.22. 21:00 | 12 |
| 2022.01.22. 21:15 | 12 |
| 2022.01.22. 21:30 | 12 |
| 2022.01.22. 21:45 | 12 |
| 2022.01.22. 22:00 | 12 |
| 2022.01.22. 22:15 | 12 |
| 2022.01.22. 22:30 | 12 |
| 2022.01.22. 22:45 | 12 |
| 2022.01.22. 23:00 | 12 |
| 2022.01.22. 23:15 | 12 |
| 2022.01.22. 23:30 | 12 |
| 2022.01.22. 23:45 | 12 |
| 2022.01.23. 00:00 | 12 |
| 2022.01.23. 00:15 | 12 |
| 2022.01.23. 00:30 | 12 |
| 2022.01.23. 00:45 | 12 |
| 2022.01.23. 01:00 | 12 |
| 2022.01.23. 01:15 | 12 |
| 2022.01.23. 01:30 | 12 |
| 2022.01.23. 01:45 | 12 |
| 2022.01.23. 02:00 | 12 |
| 2022.01.23. 02:15 | 12 |
| 2022.01.23. 02:30 | 12 |
| 2022.01.23. 02:45 | 12 |
| 2022.01.23. 03:00 | 12 |
| 2022.01.23. 03:15 | 12 |
| 2022.01.23. 03:30 | 12 |
| 2022.01.23. 03:45 | 12 |
| 2022.01.23. 04:00 | 12 |
| 2022.01.23. 04:15 | 12 |
| 2022.01.23. 04:30 | 12 |
| 2022.01.23. 04:45 | 12 |
| 2022.01.23. 05:00 | 12 |
| 2022.01.23. 05:15 | 12 |
| 2022.01.23. 05:30 | 12 |
| 2022.01.23. 05:45 | 12 |
| 2022.01.23. 06:00 | 12 |
| 2022.01.23. 06:15 | 12 |
| 2022.01.23. 06:30 | 12 |
| 2022.01.23. 06:45 | 12 |
| 2022.01.23. 07:00 | 12 |
| 2022.01.23. 07:15 | 12 |
| 2022.01.23. 07:30 | 12 |
| 2022.01.23. 07:45 | 12 |
| 2022.01.23. 08:00 | 12 |
| 2022.01.23. 08:15 | 12 |
| 2022.01.23. 08:30 | 12 |
| 2022.01.23. 08:45 | 12 |
| 2022.01.23. 09:00 | 12 |
| 2022.01.23. 09:15 | 12 |
| 2022.01.23. 09:30 | 12 |
| 2022.01.23. 09:45 | 12 |
| 2022.01.23. 10:00 | 12 |
| 2022.01.23. 10:15 | 12 |
| 2022.01.23. 10:30 | 12 |
| 2022.01.23. 10:45 | 12 |
| 2022.01.23. 11:00 | 12 |
| 2022.01.23. 11:15 | 12 |
| 2022.01.23. 11:30 | 12 |
| 2022.01.23. 11:45 | 12 |
| 2022.01.23. 12:00 | 12 |
| 2022.01.23. 12:15 | 12 |
| 2022.01.23. 12:30 | 12 |
| 2022.01.23. 12:45 | 12 |
| 2022.01.23. 13:00 | 12 |
| 2022.01.23. 13:15 | 12 |
| 2022.01.23. 13:30 | 12 |
| 2022.01.23. 13:45 | 12 |
| 2022.01.23. 14:00 | 12 |
| 2022.01.23. 14:15 | 12 |
| 2022.01.23. 14:30 | 12 |
| 2022.01.23. 14:45 | 12 |
| 2022.01.23. 15:00 | 12 |
| 2022.01.23. 15:15 | 12 |
| 2022.01.23. 15:30 | 12 |
| 2022.01.23. 15:45 | 12 |
| 2022.01.23. 16:00 | 12 |
| 2022.01.23. 16:15 | 12 |
| 2022.01.23. 16:30 | 12 |
| 2022.01.23. 16:45 | 12 |
| 2022.01.23. 17:00 | 12 |
| 2022.01.23. 17:15 | 12 |
| 2022.01.23. 17:30 | 12 |
| 2022.01.23. 17:45 | 12 |
| 2022.01.23. 18:00 | 12 |
| 2022.01.23. 18:15 | 12 |
| 2022.01.23. 18:30 | 12 |
| 2022.01.23. 18:45 | 12 |
| 2022.01.23. 19:00 | 12 |
| 2022.01.23. 19:15 | 12 |
| 2022.01.23. 19:30 | 12 |
| 2022.01.23. 19:45 | 12 |
| 2022.01.23. 20:00 | 12 |
| 2022.01.23. 20:15 | 12 |
| 2022.01.23. 20:30 | 12 |
| 2022.01.23. 20:45 | 12 |
| 2022.01.23. 21:00 | 12 |
| 2022.01.23. 21:15 | 12 |
| 2022.01.23. 21:30 | 12 |
| 2022.01.23. 21:45 | 12 |
| 2022.01.23. 22:00 | 12 |
| 2022.01.23. 22:15 | 12 |
| 2022.01.23. 22:30 | 12 |
| 2022.01.23. 22:45 | 12 |
| 2022.01.23. 23:00 | 12 |
| 2022.01.23. 23:15 | 12 |
| 2022.01.23. 23:30 | 12 |
| 2022.01.23. 23:45 | 12 |
| 2022.01.24. 00:00 | 12 |
| 2022.01.24. 00:15 | 12 |
| 2022.01.24. 00:30 | 12 |
| 2022.01.24. 00:45 | 12 |
| 2022.01.24. 01:00 | 12 |
| 2022.01.24. 01:15 | 12 |
| 2022.01.24. 01:30 | 12 |
| 2022.01.24. 01:45 | 12 |
| 2022.01.24. 02:00 | 12 |
| 2022.01.24. 02:15 | 12 |
| 2022.01.24. 02:30 | 12 |
| 2022.01.24. 02:45 | 12 |
| 2022.01.24. 03:00 | 12 |
| 2022.01.24. 03:15 | 12 |
| 2022.01.24. 03:30 | 12 |
| 2022.01.24. 03:45 | 12 |
| 2022.01.24. 04:00 | 12 |
| 2022.01.24. 04:15 | 12 |
| 2022.01.24. 04:30 | 12 |
| 2022.01.24. 04:45 | 12 |
| 2022.01.24. 05:00 | 12 |
| 2022.01.24. 05:15 | 12 |
| 2022.01.24. 05:30 | 12 |
| 2022.01.24. 05:45 | 12 |
| 2022.01.24. 06:00 | 12 |
| 2022.01.24. 06:15 | 12 |
| 2022.01.24. 06:30 | 12 |
| 2022.01.24. 06:45 | 12 |
| 2022.01.24. 07:00 | 12 |
| 2022.01.24. 07:15 | 12 |
| 2022.01.24. 07:30 | 12 |
| 2022.01.24. 07:45 | 12 |
| 2022.01.24. 08:00 | 12 |
| 2022.01.24. 08:15 | 12 |
| 2022.01.24. 08:30 | 12 |
| 2022.01.24. 08:45 | 12 |
| 2022.01.24. 09:00 | 12 |
| 2022.01.24. 09:15 | 12 |
| 2022.01.24. 09:30 | 12 |
| 2022.01.24. 09:45 | 12 |
| 2022.01.24. 10:00 | 12 |
| 2022.01.24. 10:15 | 12 |
| 2022.01.24. 10:30 | 12 |
| 2022.01.24. 10:45 | 12 |
| 2022.01.24. 11:00 | 12 |
| 2022.01.24. 11:15 | 12 |
| 2022.01.24. 11:30 | 12 |
| 2022.01.24. 11:45 | 12 |
| 2022.01.24. 12:00 | 12 |
| 2022.01.24. 12:15 | 12 |
| 2022.01.24. 12:30 | 12 |
| 2022.01.24. 12:45 | 12 |
| 2022.01.24. 13:00 | 12 |
| 2022.01.24. 13:15 | 12 |
| 2022.01.24. 13:30 | 12 |
| 2022.01.24. 13:45 | 12 |
| 2022.01.24. 14:00 | 12 |
| 2022.01.24. 14:15 | 12 |
| 2022.01.24. 14:30 | 12 |
| 2022.01.24. 14:45 | 12 |
| 2022.01.24. 15:00 | 12 |
| 2022.01.24. 15:15 | 12 |
| 2022.01.24. 15:30 | 12 |
| 2022.01.24. 15:45 | 12 |
| 2022.01.24. 16:00 | 12 |
| 2022.01.24. 16:15 | 12 |
| 2022.01.24. 16:30 | 12 |
| 2022.01.24. 16:45 | 12 |
| 2022.01.24. 17:00 | 12 |
| 2022.01.24. 17:15 | 12 |
| 2022.01.24. 17:30 | 12 |
| 2022.01.24. 17:45 | 12 |
| 2022.01.24. 18:00 | 12 |
| 2022.01.24. 18:15 | 12 |
| 2022.01.24. 18:30 | 12 |
| 2022.01.24. 18:45 | 12 |
| 2022.01.24. 19:00 | 12 |
| 2022.01.24. 19:15 | 12 |
| 2022.01.24. 19:30 | 12 |
| 2022.01.24. 19:45 | 12 |
| 2022.01.24. 20:00 | 12 |
| 2022.01.24. 20:15 | 12 |
| 2022.01.24. 20:30 | 12 |
| 2022.01.24. 20:45 | 12 |
| 2022.01.24. 21:00 | 12 |
| 2022.01.24. 21:15 | 12 |
| 2022.01.24. 21:30 | 12 |
| 2022.01.24. 21:45 | 12 |
| 2022.01.24. 22:00 | 12 |
| 2022.01.24. 22:15 | 12 |
| 2022.01.24. 22:30 | 12 |
| 2022.01.24. 22:45 | 12 |
| 2022.01.24. 23:00 | 12 |
| 2022.01.24. 23:15 | 12 |
| 2022.01.24. 23:30 | 12 |
| 2022.01.24. 23:45 | 12 |
| 2022.01.25. 00:00 | 12 |
| 2022.01.25. 00:15 | 12 |
| 2022.01.25. 00:30 | 12 |
| 2022.01.25. 00:45 | 12 |
| 2022.01.25. 01:00 | 12 |
| 2022.01.25. 01:15 | 12 |
| 2022.01.25. 01:30 | 12 |
| 2022.01.25. 01:45 | 12 |
| 2022.01.25. 02:00 | 12 |
| 2022.01.25. 02:15 | 12 |
| 2022.01.25. 02:30 | 12 |
| 2022.01.25. 02:45 | 12 |
| 2022.01.25. 03:00 | 12 |
| 2022.01.25. 03:15 | 12 |
| 2022.01.25. 03:30 | 12 |
| 2022.01.25. 03:45 | 12 |
| 2022.01.25. 04:00 | 12 |
| 2022.01.25. 04:15 | 12 |
| 2022.01.25. 04:30 | 12 |
| 2022.01.25. 04:45 | 12 |
| 2022.01.25. 05:00 | 12 |
| 2022.01.25. 05:15 | 12 |
| 2022.01.25. 05:30 | 12 |
| 2022.01.25. 05:45 | 12 |
| 2022.01.25. 06:00 | 12 |
| 2022.01.25. 06:15 | 12 |
| 2022.01.25. 06:30 | 12 |
| 2022.01.25. 06:45 | 12 |
| 2022.01.25. 07:00 | 12 |
| 2022.01.25. 07:15 | 12 |
| 2022.01.25. 07:30 | 12 |
| 2022.01.25. 07:45 | 12 |
| 2022.01.25. 08:00 | 12 |
| 2022.01.25. 08:15 | 12 |
| 2022.01.25. 08:30 | 12 |
| 2022.01.25. 08:45 | 12 |
| 2022.01.25. 09:00 | 12 |
| 2022.01.25. 09:15 | 12 |
| 2022.01.25. 09:30 | 12 |
| 2022.01.25. 09:45 | 12 |
| 2022.01.25. 10:00 | 12 |
| 2022.01.25. 10:15 | 12 |
| 2022.01.25. 10:30 | 12 |
| 2022.01.25. 10:45 | 12 |
| 2022.01.25. 11:00 | 12 |
| 2022.01.25. 11:15 | 12 |
| 2022.01.25. 11:30 | 12 |
| 2022.01.25. 11:45 | 12 |
| 2022.01.25. 12:00 | 12 |
| 2022.01.25. 12:15 | 12 |
| 2022.01.25. 12:30 | 12 |
| 2022.01.25. 12:45 | 12 |
| 2022.01.25. 13:00 | 12 |
| 2022.01.25. 13:15 | 12 |
| 2022.01.25. 13:30 | 12 |
| 2022.01.25. 13:45 | 12 |
| 2022.01.25. 14:00 | 12 |
| 2022.01.25. 14:15 | 12 |
| 2022.01.25. 14:30 | 12 |
| 2022.01.25. 14:45 | 12 |
| 2022.01.25. 15:00 | 12 |
| 2022.01.25. 15:15 | 12 |
| 2022.01.25. 15:30 | 12 |
| 2022.01.25. 15:45 | 12 |
| 2022.01.25. 16:00 | 12 |
| 2022.01.25. 16:15 | 12 |
| 2022.01.25. 16:30 | 12 |
| 2022.01.25. 16:45 | 12 |
| 2022.01.25. 17:00 | 12 |
| 2022.01.25. 17:15 | 12 |
| 2022.01.25. 17:30 | 12 |
| 2022.01.25. 17:45 | 12 |
| 2022.01.25. 18:00 | 12 |
| 2022.01.25. 18:15 | 12 |
| 2022.01.25. 18:30 | 12 |
| 2022.01.25. 18:45 | 12 |
| 2022.01.25. 19:00 | 12 |
| 2022.01.25. 19:15 | 12 |
| 2022.01.25. 19:30 | 12 |
| 2022.01.25. 19:45 | 12 |
| 2022.01.25. 20:00 | 12 |
| 2022.01.25. 20:15 | 12 |
| 2022.01.25. 20:30 | 12 |
| 2022.01.25. 20:45 | 12 |
| 2022.01.25. 21:00 | 12 |
| 2022.01.25. 21:15 | 12 |
| 2022.01.25. 21:30 | 12 |
| 2022.01.25. 21:45 | 12 |
| 2022.01.25. 22:00 | 12 |
| 2022.01.25. 22:15 | 12 |
| 2022.01.25. 22:30 | 12 |
| 2022.01.25. 22:45 | 12 |
| 2022.01.25. 23:00 | 12 |
| 2022.01.25. 23:15 | 12 |
| 2022.01.25. 23:30 | 12 |
| 2022.01.25. 23:45 | 12 |
| 2022.01.26. 00:00 | 12 |
| 2022.01.26. 00:15 | 12 |
| 2022.01.26. 00:30 | 12 |
| 2022.01.26. 00:45 | 12 |
| 2022.01.26. 01:00 | 12 |
| 2022.01.26. 01:15 | 12 |
| 2022.01.26. 01:30 | 12 |
| 2022.01.26. 01:45 | 12 |
| 2022.01.26. 02:00 | 12 |
| 2022.01.26. 02:15 | 12 |
| 2022.01.26. 02:30 | 12 |
| 2022.01.26. 02:45 | 12 |
| 2022.01.26. 03:00 | 12 |
| 2022.01.26. 03:15 | 12 |
| 2022.01.26. 03:30 | 12 |
| 2022.01.26. 03:45 | 12 |
| 2022.01.26. 04:00 | 12 |
| 2022.01.26. 04:15 | 12 |
| 2022.01.26. 04:30 | 12 |
| 2022.01.26. 04:45 | 12 |
| 2022.01.26. 05:00 | 12 |
| 2022.01.26. 05:15 | 12 |
| 2022.01.26. 05:30 | 12 |
| 2022.01.26. 05:45 | 12 |
| 2022.01.26. 06:00 | 12 |
| 2022.01.26. 06:15 | 12 |
| 2022.01.26. 06:30 | 12 |
| 2022.01.26. 06:45 | 12 |
| 2022.01.26. 07:00 | 12 |
| 2022.01.26. 07:15 | 12 |
| 2022.01.26. 07:30 | 12 |
| 2022.01.26. 07:45 | 12 |
| 2022.01.26. 08:00 | 12 |
| 2022.01.26. 08:15 | 12 |
| 2022.01.26. 08:30 | 12 |
| 2022.01.26. 08:45 | 12 |
| 2022.01.26. 09:00 | 12 |
| 2022.01.26. 09:15 | 12 |
| 2022.01.26. 09:30 | 12 |
| 2022.01.26. 09:45 | 12 |
| 2022.01.26. 10:00 | 12 |
| 2022.01.26. 10:15 | 12 |
| 2022.01.26. 10:30 | 12 |
| 2022.01.26. 10:45 | 12 |
| 2022.01.26. 11:00 | 12 |
| 2022.01.26. 11:15 | 12 |
| 2022.01.26. 11:30 | 12 |
| 2022.01.26. 11:45 | 12 |
| 2022.01.26. 12:00 | 12 |
| 2022.01.26. 12:15 | 12 |
| 2022.01.26. 12:30 | 12 |
| 2022.01.26. 12:45 | 12 |
| 2022.01.26. 13:00 | 12 |
| 2022.01.26. 13:15 | 12 |
| 2022.01.26. 13:30 | 12 |
| 2022.01.26. 13:45 | 12 |
| 2022.01.26. 14:00 | 12 |
| 2022.01.26. 14:15 | 12 |
| 2022.01.26. 14:30 | 12 |
| 2022.01.26. 14:45 | 12 |
| 2022.01.26. 15:00 | 12 |
| 2022.01.26. 15:15 | 12 |
| 2022.01.26. 15:30 | 12 |
| 2022.01.26. 15:45 | 12 |
| 2022.01.26. 16:00 | 12 |
| 2022.01.26. 16:15 | 12 |
| 2022.01.26. 16:30 | 12 |
| 2022.01.26. 16:45 | 12 |
| 2022.01.26. 17:00 | 12 |
| 2022.01.26. 17:15 | 12 |
| 2022.01.26. 17:30 | 12 |
| 2022.01.26. 17:45 | 12 |
| 2022.01.26. 18:00 | 12 |
| 2022.01.26. 18:15 | 12 |
| 2022.01.26. 18:30 | 12 |
| 2022.01.26. 18:45 | 12 |
| 2022.01.26. 19:00 | 12 |
| 2022.01.26. 19:15 | 12 |
| 2022.01.26. 19:30 | 12 |
| 2022.01.26. 19:45 | 12 |
| 2022.01.26. 20:00 | 12 |
| 2022.01.26. 20:15 | 12 |
| 2022.01.26. 20:30 | 12 |
| 2022.01.26. 20:45 | 12 |
| 2022.01.26. 21:00 | 12 |
| 2022.01.26. 21:15 | 12 |
| 2022.01.26. 21:30 | 12 |
| 2022.01.26. 21:45 | 12 |
| 2022.01.26. 22:00 | 12 |
| 2022.01.26. 22:15 | 12 |
| 2022.01.26. 22:30 | 12 |
| 2022.01.26. 22:45 | 12 |
| 2022.01.26. 23:00 | 12 |
| 2022.01.26. 23:15 | 12 |
| 2022.01.26. 23:30 | 12 |
| 2022.01.26. 23:45 | 12 |
| 2022.01.27. 00:00 | 12 |
| 2022.01.27. 00:15 | 12 |
| 2022.01.27. 00:30 | 12 |
| 2022.01.27. 00:45 | 12 |
| 2022.01.27. 01:00 | 12 |
| 2022.01.27. 01:15 | 12 |
| 2022.01.27. 01:30 | 12 |
| 2022.01.27. 01:45 | 12 |
| 2022.01.27. 02:00 | 12 |
| 2022.01.27. 02:15 | 12 |
| 2022.01.27. 02:30 | 12 |
| 2022.01.27. 02:45 | 12 |
| 2022.01.27. 03:00 | 12 |
| 2022.01.27. 03:15 | 12 |
| 2022.01.27. 03:30 | 12 |
| 2022.01.27. 03:45 | 12 |
| 2022.01.27. 04:00 | 12 |
| 2022.01.27. 04:15 | 12 |
| 2022.01.27. 04:30 | 12 |
| 2022.01.27. 04:45 | 12 |
| 2022.01.27. 05:00 | 12 |
| 2022.01.27. 05:15 | 12 |
| 2022.01.27. 05:30 | 12 |
| 2022.01.27. 05:45 | 12 |
| 2022.01.27. 06:00 | 12 |
| 2022.01.27. 06:15 | 12 |
| 2022.01.27. 06:30 | 12 |
| 2022.01.27. 06:45 | 12 |
| 2022.01.27. 07:00 | 12 |
| 2022.01.27. 07:15 | 12 |
| 2022.01.27. 07:30 | 12 |
| 2022.01.27. 07:45 | 12 |
| 2022.01.27. 08:00 | 12 |
| 2022.01.27. 08:15 | 12 |
| 2022.01.27. 08:30 | 12 |
| 2022.01.27. 08:45 | 12 |
| 2022.01.27. 09:00 | 12 |
| 2022.01.27. 09:15 | 12 |
| 2022.01.27. 09:30 | 12 |
| 2022.01.27. 09:45 | 12 |
| 2022.01.27. 10:00 | 12 |
| 2022.01.27. 10:15 | 12 |
| 2022.01.27. 10:30 | 12 |
| 2022.01.27. 10:45 | 12 |
| 2022.01.27. 11:00 | 12 |
| 2022.01.27. 11:15 | 12 |
| 2022.01.27. 11:30 | 12 |
| 2022.01.27. 11:45 | 12 |
| 2022.01.27. 12:00 | 12 |
| 2022.01.27. 12:15 | 12 |
| 2022.01.27. 12:30 | 12 |
| 2022.01.27. 12:45 | 12 |
| 2022.01.27. 13:00 | 12 |
| 2022.01.27. 13:15 | 12 |
| 2022.01.27. 13:30 | 12 |
| 2022.01.27. 13:45 | 12 |
| 2022.01.27. 14:00 | 12 |
| 2022.01.27. 14:15 | 12 |
| 2022.01.27. 14:30 | 12 |
| 2022.01.27. 14:45 | 12 |
| 2022.01.27. 15:00 | 12 |
| 2022.01.27. 15:15 | 12 |
| 2022.01.27. 15:30 | 12 |
| 2022.01.27. 15:45 | 12 |
| 2022.01.27. 16:00 | 12 |
| 2022.01.27. 16:15 | 12 |
| 2022.01.27. 16:30 | 12 |
| 2022.01.27. 16:45 | 12 |
| 2022.01.27. 17:00 | 12 |
| 2022.01.27. 17:15 | 12 |
| 2022.01.27. 17:30 | 12 |
| 2022.01.27. 17:45 | 12 |
| 2022.01.27. 18:00 | 12 |
| 2022.01.27. 18:15 | 12 |
| 2022.01.27. 18:30 | 12 |
| 2022.01.27. 18:45 | 12 |
| 2022.01.27. 19:00 | 12 |
| 2022.01.27. 19:15 | 12 |
| 2022.01.27. 19:30 | 12 |
| 2022.01.27. 19:45 | 12 |
| 2022.01.27. 20:00 | 12 |
| 2022.01.27. 20:15 | 12 |
| 2022.01.27. 20:30 | 12 |
| 2022.01.27. 20:45 | 12 |
| 2022.01.27. 21:00 | 12 |
| 2022.01.27. 21:15 | 12 |
| 2022.01.27. 21:30 | 12 |
| 2022.01.27. 21:45 | 12 |
| 2022.01.27. 22:00 | 12 |
| 2022.01.27. 22:15 | 12 |
| 2022.01.27. 22:30 | 12 |
| 2022.01.27. 22:45 | 12 |
| 2022.01.27. 23:00 | 12 |
| 2022.01.27. 23:15 | 12 |
| 2022.01.27. 23:30 | 12 |
| 2022.01.27. 23:45 | 12 |
| 2022.01.28. 00:00 | 12 |
| 2022.01.28. 00:15 | 12 |
| 2022.01.28. 00:30 | 12 |
| 2022.01.28. 00:45 | 12 |
| 2022.01.28. 01:00 | 12 |
| 2022.01.28. 01:15 | 12 |
| 2022.01.28. 01:30 | 12 |
| 2022.01.28. 01:45 | 12 |
| 2022.01.28. 02:00 | 12 |
| 2022.01.28. 02:15 | 12 |
| 2022.01.28. 02:30 | 12 |
| 2022.01.28. 02:45 | 12 |
| 2022.01.28. 03:00 | 12 |
| 2022.01.28. 03:15 | 12 |
| 2022.01.28. 03:30 | 12 |
| 2022.01.28. 03:45 | 12 |
| 2022.01.28. 04:00 | 12 |
| 2022.01.28. 04:15 | 12 |
| 2022.01.28. 04:30 | 12 |
| 2022.01.28. 04:45 | 12 |
| 2022.01.28. 05:00 | 12 |
| 2022.01.28. 05:15 | 12 |
| 2022.01.28. 05:30 | 12 |
| 2022.01.28. 05:45 | 12 |
| 2022.01.28. 06:00 | 12 |
| 2022.01.28. 06:15 | 12 |
| 2022.01.28. 06:30 | 12 |
| 2022.01.28. 06:45 | 12 |
| 2022.01.28. 07:00 | 12 |
| 2022.01.28. 07:15 | 12 |
| 2022.01.28. 07:30 | 12 |
| 2022.01.28. 07:45 | 12 |
| 2022.01.28. 08:00 | 12 |
| 2022.01.28. 08:15 | 12 |
| 2022.01.28. 08:30 | 12 |
| 2022.01.28. 08:45 | 12 |
| 2022.01.28. 09:00 | 12 |
| 2022.01.28. 09:15 | 12 |
| 2022.01.28. 09:30 | 12 |
| 2022.01.28. 09:45 | 12 |
| 2022.01.28. 10:00 | 12 |
| 2022.01.28. 10:15 | 12 |
| 2022.01.28. 10:30 | 12 |
| 2022.01.28. 10:45 | 12 |
| 2022.01.28. 11:00 | 12 |
| 2022.01.28. 11:15 | 12 |
| 2022.01.28. 11:30 | 12 |
| 2022.01.28. 11:45 | 12 |
| 2022.01.28. 12:00 | 12 |
| 2022.01.28. 12:15 | 12 |
| 2022.01.28. 12:30 | 12 |
| 2022.01.28. 12:45 | 12 |
| 2022.01.28. 13:00 | 12 |
| 2022.01.28. 13:15 | 12 |
| 2022.01.28. 13:30 | 12 |
| 2022.01.28. 13:45 | 12 |
| 2022.01.28. 14:00 | 12 |
| 2022.01.28. 14:15 | 12 |
| 2022.01.28. 14:30 | 12 |
| 2022.01.28. 14:45 | 12 |
| 2022.01.28. 15:00 | 12 |
| 2022.01.28. 15:15 | 12 |
| 2022.01.28. 15:30 | 12 |
| 2022.01.28. 15:45 | 12 |
| 2022.01.28. 16:00 | 12 |
| 2022.01.28. 16:15 | 12 |
| 2022.01.28. 16:30 | 12 |
| 2022.01.28. 16:45 | 12 |
| 2022.01.28. 17:00 | 12 |
| 2022.01.28. 17:15 | 12 |
| 2022.01.28. 17:30 | 12 |
| 2022.01.28. 17:45 | 12 |
| 2022.01.28. 18:00 | 12 |
| 2022.01.28. 18:15 | 12 |
| 2022.01.28. 18:30 | 12 |
| 2022.01.28. 18:45 | 12 |
| 2022.01.28. 19:00 | 12 |
| 2022.01.28. 19:15 | 12 |
| 2022.01.28. 19:30 | 12 |
| 2022.01.28. 19:45 | 12 |
| 2022.01.28. 20:00 | 12 |
| 2022.01.28. 20:15 | 12 |
| 2022.01.28. 20:30 | 12 |
| 2022.01.28. 20:45 | 12 |
| 2022.01.28. 21:00 | 12 |
| 2022.01.28. 21:15 | 12 |
| 2022.01.28. 21:30 | 12 |
| 2022.01.28. 21:45 | 12 |
| 2022.01.28. 22:00 | 12 |
| 2022.01.28. 22:15 | 12 |
| 2022.01.28. 22:30 | 12 |
| 2022.01.28. 22:45 | 12 |
| 2022.01.28. 23:00 | 12 |
| 2022.01.28. 23:15 | 12 |
| 2022.01.28. 23:30 | 12 |
| 2022.01.28. 23:45 | 12 |
| 2022.01.29. 00:00 | 12 |
| 2022.01.29. 00:15 | 12 |
| 2022.01.29. 00:30 | 12 |
| 2022.01.29. 00:45 | 12 |
| 2022.01.29. 01:00 | 12 |
| 2022.01.29. 01:15 | 12 |
| 2022.01.29. 01:30 | 12 |
| 2022.01.29. 01:45 | 12 |
| 2022.01.29. 02:00 | 12 |
| 2022.01.29. 02:15 | 12 |
| 2022.01.29. 02:30 | 12 |
| 2022.01.29. 02:45 | 12 |
| 2022.01.29. 03:00 | 12 |
| 2022.01.29. 03:15 | 12 |
| 2022.01.29. 03:30 | 12 |
| 2022.01.29. 03:45 | 12 |
| 2022.01.29. 04:00 | 12 |
| 2022.01.29. 04:15 | 12 |
| 2022.01.29. 04:30 | 12 |
| 2022.01.29. 04:45 | 12 |
| 2022.01.29. 05:00 | 12 |
| 2022.01.29. 05:15 | 12 |
| 2022.01.29. 05:30 | 12 |
| 2022.01.29. 05:45 | 12 |
| 2022.01.29. 06:00 | 12 |
| 2022.01.29. 06:15 | 12 |
| 2022.01.29. 06:30 | 12 |
| 2022.01.29. 06:45 | 12 |
| 2022.01.29. 07:00 | 12 |
| 2022.01.29. 07:15 | 12 |
| 2022.01.29. 07:30 | 12 |
| 2022.01.29. 07:45 | 12 |
| 2022.01.29. 08:00 | 12 |
| 2022.01.29. 08:15 | 12 |
| 2022.01.29. 08:30 | 12 |
| 2022.01.29. 08:45 | 12 |
| 2022.01.29. 09:00 | 12 |
| 2022.01.29. 09:15 | 12 |
| 2022.01.29. 09:30 | 12 |
| 2022.01.29. 09:45 | 12 |
| 2022.01.29. 10:00 | 12 |
| 2022.01.29. 10:15 | 12 |
| 2022.01.29. 10:30 | 12 |
| 2022.01.29. 10:45 | 12 |
| 2022.01.29. 11:00 | 12 |
| 2022.01.29. 11:15 | 12 |
| 2022.01.29. 11:30 | 12 |
| 2022.01.29. 11:45 | 12 |
| 2022.01.29. 12:00 | 12 |
| 2022.01.29. 12:15 | 12 |
| 2022.01.29. 12:30 | 12 |
| 2022.01.29. 12:45 | 12 |
| 2022.01.29. 13:00 | 12 |
| 2022.01.29. 13:15 | 12 |
| 2022.01.29. 13:30 | 12 |
| 2022.01.29. 13:45 | 12 |
| 2022.01.29. 14:00 | 12 |
| 2022.01.29. 14:15 | 12 |
| 2022.01.29. 14:30 | 12 |
| 2022.01.29. 14:45 | 12 |
| 2022.01.29. 15:00 | 12 |
| 2022.01.29. 15:15 | 12 |
| 2022.01.29. 15:30 | 12 |
| 2022.01.29. 15:45 | 12 |
| 2022.01.29. 16:00 | 12 |
| 2022.01.29. 16:15 | 12 |
| 2022.01.29. 16:30 | 12 |
| 2022.01.29. 16:45 | 12 |
| 2022.01.29. 17:00 | 12 |
| 2022.01.29. 17:15 | 12 |
| 2022.01.29. 17:30 | 12 |
| 2022.01.29. 17:45 | 12 |
| 2022.01.29. 18:00 | 12 |
| 2022.01.29. 18:15 | 12 |
| 2022.01.29. 18:30 | 12 |
| 2022.01.29. 18:45 | 12 |
| 2022.01.29. 19:00 | 12 |
| 2022.01.29. 19:15 | 12 |
| 2022.01.29. 19:30 | 12 |
| 2022.01.29. 19:45 | 12 |
| 2022.01.29. 20:00 | 12 |
| 2022.01.29. 20:15 | 12 |
| 2022.01.29. 20:30 | 12 |
| 2022.01.29. 20:45 | 12 |
| 2022.01.29. 21:00 | 12 |
| 2022.01.29. 21:15 | 12 |
| 2022.01.29. 21:30 | 12 |
| 2022.01.29. 21:45 | 12 |
| 2022.01.29. 22:00 | 12 |
| 2022.01.29. 22:15 | 12 |
| 2022.01.29. 22:30 | 12 |
| 2022.01.29. 22:45 | 12 |
| 2022.01.29. 23:00 | 12 |
| 2022.01.29. 23:15 | 12 |
| 2022.01.29. 23:30 | 12 |
| 2022.01.29. 23:45 | 12 |
| 2022.01.30. 00:00 | 12 |
| 2022.01.30. 00:15 | 12 |
| 2022.01.30. 00:30 | 12 |
| 2022.01.30. 00:45 | 12 |
| 2022.01.30. 01:00 | 12 |
| 2022.01.30. 01:15 | 12 |
| 2022.01.30. 01:30 | 12 |
| 2022.01.30. 01:45 | 12 |
| 2022.01.30. 02:00 | 12 |
| 2022.01.30. 02:15 | 12 |
| 2022.01.30. 02:30 | 12 |
| 2022.01.30. 02:45 | 12 |
| 2022.01.30. 03:00 | 12 |
| 2022.01.30. 03:15 | 12 |
| 2022.01.30. 03:30 | 12 |
| 2022.01.30. 03:45 | 12 |
| 2022.01.30. 04:00 | 12 |
| 2022.01.30. 04:15 | 12 |
| 2022.01.30. 04:30 | 12 |
| 2022.01.30. 04:45 | 12 |
| 2022.01.30. 05:00 | 12 |
| 2022.01.30. 05:15 | 12 |
| 2022.01.30. 05:30 | 12 |
| 2022.01.30. 05:45 | 12 |
| 2022.01.30. 06:00 | 12 |
| 2022.01.30. 06:15 | 12 |
| 2022.01.30. 06:30 | 12 |
| 2022.01.30. 06:45 | 12 |
| 2022.01.30. 07:00 | 12 |
| 2022.01.30. 07:15 | 12 |
| 2022.01.30. 07:30 | 12 |
| 2022.01.30. 07:45 | 12 |
| 2022.01.30. 08:00 | 12 |
| 2022.01.30. 08:15 | 12 |
| 2022.01.30. 08:30 | 12 |
| 2022.01.30. 08:45 | 12 |
| 2022.01.30. 09:00 | 12 |
| 2022.01.30. 09:15 | 12 |
| 2022.01.30. 09:30 | 12 |
| 2022.01.30. 09:45 | 12 |
| 2022.01.30. 10:00 | 12 |
| 2022.01.30. 10:15 | 12 |
| 2022.01.30. 10:30 | 12 |
| 2022.01.30. 10:45 | 12 |
| 2022.01.30. 11:00 | 12 |
| 2022.01.30. 11:15 | 12 |
| 2022.01.30. 11:30 | 12 |
| 2022.01.30. 11:45 | 12 |
| 2022.01.30. 12:00 | 12 |
| 2022.01.30. 12:15 | 12 |
| 2022.01.30. 12:30 | 12 |
| 2022.01.30. 12:45 | 12 |
| 2022.01.30. 13:00 | 12 |
| 2022.01.30. 13:15 | 12 |
| 2022.01.30. 13:30 | 12 |
| 2022.01.30. 13:45 | 12 |
| 2022.01.30. 14:00 | 12 |
| 2022.01.30. 14:15 | 12 |
| 2022.01.30. 14:30 | 12 |
| 2022.01.30. 14:45 | 12 |
| 2022.01.30. 15:00 | 12 |
| 2022.01.30. 15:15 | 12 |
| 2022.01.30. 15:30 | 12 |
| 2022.01.30. 15:45 | 12 |
| 2022.01.30. 16:00 | 12 |
| 2022.01.30. 16:15 | 12 |
| 2022.01.30. 16:30 | 12 |
| 2022.01.30. 16:45 | 12 |
| 2022.01.30. 17:00 | 12 |
| 2022.01.30. 17:15 | 12 |
| 2022.01.30. 17:30 | 12 |
| 2022.01.30. 17:45 | 12 |
| 2022.01.30. 18:00 | 12 |
| 2022.01.30. 18:15 | 12 |
| 2022.01.30. 18:30 | 12 |
| 2022.01.30. 18:45 | 12 |
| 2022.01.30. 19:00 | 12 |
| 2022.01.30. 19:15 | 12 |
| 2022.01.30. 19:30 | 12 |
| 2022.01.30. 19:45 | 12 |
| 2022.01.30. 20:00 | 12 |
| 2022.01.30. 20:15 | 12 |
| 2022.01.30. 20:30 | 12 |
| 2022.01.30. 20:45 | 12 |
| 2022.01.30. 21:00 | 12 |
| 2022.01.30. 21:15 | 12 |
| 2022.01.30. 21:30 | 12 |
| 2022.01.30. 21:45 | 12 |
| 2022.01.30. 22:00 | 12 |
| 2022.01.30. 22:15 | 12 |
| 2022.01.30. 22:30 | 12 |
| 2022.01.30. 22:45 | 12 |
| 2022.01.30. 23:00 | 12 |
| 2022.01.30. 23:15 | 12 |
| 2022.01.30. 23:30 | 12 |
| 2022.01.30. 23:45 | 12 |
| 2022.01.31. 00:00 | 12 |
| 2022.01.31. 00:15 | 12 |
| 2022.01.31. 00:30 | 12 |
| 2022.01.31. 00:45 | 12 |
| 2022.01.31. 01:00 | 12 |
| 2022.01.31. 01:15 | 12 |
| 2022.01.31. 01:30 | 12 |
| 2022.01.31. 01:45 | 12 |
| 2022.01.31. 02:00 | 12 |
| 2022.01.31. 02:15 | 12 |
| 2022.01.31. 02:30 | 12 |
| 2022.01.31. 02:45 | 12 |
| 2022.01.31. 03:00 | 12 |
| 2022.01.31. 03:15 | 12 |
| 2022.01.31. 03:30 | 12 |
| 2022.01.31. 03:45 | 12 |
| 2022.01.31. 04:00 | 12 |
| 2022.01.31. 04:15 | 12 |
| 2022.01.31. 04:30 | 12 |
| 2022.01.31. 04:45 | 12 |
| 2022.01.31. 05:00 | 12 |
| 2022.01.31. 05:15 | 12 |
| 2022.01.31. 05:30 | 12 |
| 2022.01.31. 05:45 | 12 |
| 2022.01.31. 06:00 | 12 |
| 2022.01.31. 06:15 | 12 |
| 2022.01.31. 06:30 | 12 |
| 2022.01.31. 06:45 | 12 |
| 2022.01.31. 07:00 | 12 |
| 2022.01.31. 07:15 | 12 |
| 2022.01.31. 07:30 | 12 |
| 2022.01.31. 07:45 | 12 |
| 2022.01.31. 08:00 | 12 |
| 2022.01.31. 08:15 | 12 |
| 2022.01.31. 08:30 | 12 |
| 2022.01.31. 08:45 | 12 |
| 2022.01.31. 09:00 | 12 |
| 2022.01.31. 09:15 | 12 |
| 2022.01.31. 09:30 | 12 |
| 2022.01.31. 09:45 | 12 |
| 2022.01.31. 10:00 | 12 |
| 2022.01.31. 10:15 | 12 |
| 2022.01.31. 10:30 | 12 |
| 2022.01.31. 10:45 | 12 |
| 2022.01.31. 11:00 | 12 |
| 2022.01.31. 11:15 | 12 |
| 2022.01.31. 11:30 | 12 |
| 2022.01.31. 11:45 | 12 |
| 2022.01.31. 12:00 | 12 |
| 2022.01.31. 12:15 | 12 |
| 2022.01.31. 12:30 | 12 |
| 2022.01.31. 12:45 | 12 |
| 2022.01.31. 13:00 | 12 |
| 2022.01.31. 13:15 | 12 |
| 2022.01.31. 13:30 | 12 |
| 2022.01.31. 13:45 | 12 |
| 2022.01.31. 14:00 | 12 |
| 2022.01.31. 14:15 | 12 |
| 2022.01.31. 14:30 | 12 |
| 2022.01.31. 14:45 | 12 |
| 2022.01.31. 15:00 | 12 |
| 2022.01.31. 15:15 | 12 |
| 2022.01.31. 15:30 | 12 |
| 2022.01.31. 15:45 | 12 |
| 2022.01.31. 16:00 | 12 |
| 2022.01.31. 16:15 | 12 |
| 2022.01.31. 16:30 | 12 |
| 2022.01.31. 16:45 | 12 |
| 2022.01.31. 17:00 | 12 |
| 2022.01.31. 17:15 | 12 |
| 2022.01.31. 17:30 | 12 |
| 2022.01.31. 17:45 | 12 |
| 2022.01.31. 18:00 | 12 |
| 2022.01.31. 18:15 | 12 |
| 2022.01.31. 18:30 | 12 |
| 2022.01.31. 18:45 | 12 |
| 2022.01.31. 19:00 | 12 |
| 2022.01.31. 19:15 | 12 |
| 2022.01.31. 19:30 | 12 |
| 2022.01.31. 19:45 | 12 |
| 2022.01.31. 20:00 | 12 |
| 2022.01.31. 20:15 | 12 |
| 2022.01.31. 20:30 | 12 |
| 2022.01.31. 20:45 | 12 |
| 2022.01.31. 21:00 | 12 |
| 2022.01.31. 21:15 | 12 |
| 2022.01.31. 21:30 | 12 |
| 2022.01.31. 21:45 | 12 |
| 2022.01.31. 22:00 | 12 |
| 2022.01.31. 22:15 | 12 |
| 2022.01.31. 22:30 | 12 |
| 2022.01.31. 22:45 | 12 |
| 2022.01.31. 23:00 | 12 |
| 2022.01.31. 23:15 | 12 |
| 2022.01.31. 23:30 | 12 |
| 2022.01.31. 23:45 | 12 |
| 2022.02.01. 00:00 | 12 |
| 2022.02.01. 00:15 | 12 |
| 2022.02.01. 00:30 | 12 |
| 2022.02.01. 00:45 | 12 |
| 2022.02.01. 01:00 | 12 |
| 2022.02.01. 01:15 | 12 |
| 2022.02.01. 01:30 | 12 |
| 2022.02.01. 01:45 | 12 |
| 2022.02.01. 02:00 | 12 |
| 2022.02.01. 02:15 | 12 |
| 2022.02.01. 02:30 | 12 |
| 2022.02.01. 02:45 | 12 |
| 2022.02.01. 03:00 | 12 |
| 2022.02.01. 03:15 | 12 |
| 2022.02.01. 03:30 | 12 |
| 2022.02.01. 03:45 | 12 |
| 2022.02.01. 04:00 | 12 |
| 2022.02.01. 04:15 | 12 |
| 2022.02.01. 04:30 | 12 |
| 2022.02.01. 04:45 | 12 |
| 2022.02.01. 05:00 | 12 |
| 2022.02.01. 05:15 | 12 |
| 2022.02.01. 05:30 | 12 |
| 2022.02.01. 05:45 | 12 |
| 2022.02.01. 06:00 | 12 |
| 2022.02.01. 06:15 | 12 |
| 2022.02.01. 06:30 | 12 |
| 2022.02.01. 06:45 | 12 |
| 2022.02.01. 07:00 | 12 |
| 2022.02.01. 07:15 | 12 |
| 2022.02.01. 07:30 | 12 |
| 2022.02.01. 07:45 | 12 |
| 2022.02.01. 08:00 | 12 |
| 2022.02.01. 08:15 | 12 |
| 2022.02.01. 08:30 | 12 |
| 2022.02.01. 08:45 | 12 |
| 2022.02.01. 09:00 | 12 |
| 2022.02.01. 09:15 | 12 |
| 2022.02.01. 09:30 | 12 |
| 2022.02.01. 09:45 | 12 |
| 2022.02.01. 10:00 | 12 |
| 2022.02.01. 10:15 | 12 |
| 2022.02.01. 10:30 | 12 |
| 2022.02.01. 10:45 | 12 |
| 2022.02.01. 11:00 | 12 |
| 2022.02.01. 11:15 | 12 |
| 2022.02.01. 11:30 | 12 |
| 2022.02.01. 11:45 | 12 |
| 2022.02.01. 12:00 | 12 |
| 2022.02.01. 12:15 | 12 |
| 2022.02.01. 12:30 | 12 |
| 2022.02.01. 12:45 | 12 |
| 2022.02.01. 13:00 | 12 |
| 2022.02.01. 13:15 | 12 |
| 2022.02.01. 13:30 | 12 |
| 2022.02.01. 13:45 | 12 |
| 2022.02.01. 14:00 | 12 |
| 2022.02.01. 14:15 | 12 |
| 2022.02.01. 14:30 | 12 |
| 2022.02.01. 14:45 | 12 |
| 2022.02.01. 15:00 | 12 |
| 2022.02.01. 15:15 | 12 |
| 2022.02.01. 15:30 | 12 |
| 2022.02.01. 15:45 | 12 |
| 2022.02.01. 16:00 | 12 |
| 2022.02.01. 16:15 | 12 |
| 2022.02.01. 16:30 | 12 |
| 2022.02.01. 16:45 | 12 |
| 2022.02.01. 17:00 | 12 |
| 2022.02.01. 17:15 | 12 |
| 2022.02.01. 17:30 | 12 |
| 2022.02.01. 17:45 | 12 |
| 2022.02.01. 18:00 | 12 |
| 2022.02.01. 18:15 | 12 |
| 2022.02.01. 18:30 | 12 |
| 2022.02.01. 18:45 | 12 |
| 2022.02.01. 19:00 | 12 |
| 2022.02.01. 19:15 | 12 |
| 2022.02.01. 19:30 | 12 |
| 2022.02.01. 19:45 | 12 |
| 2022.02.01. 20:00 | 12 |
| 2022.02.01. 20:15 | 12 |
| 2022.02.01. 20:30 | 12 |
| 2022.02.01. 20:45 | 12 |
| 2022.02.01. 21:00 | 12 |
| 2022.02.01. 21:15 | 12 |
| 2022.02.01. 21:30 | 12 |
| 2022.02.01. 21:45 | 12 |
| 2022.02.01. 22:00 | 12 |
| 2022.02.01. 22:15 | 12 |
| 2022.02.01. 22:30 | 12 |
| 2022.02.01. 22:45 | 12 |
| 2022.02.01. 23:00 | 12 |
| 2022.02.01. 23:15 | 12 |
| 2022.02.01. 23:30 | 12 |
| 2022.02.01. 23:45 | 12 |
| 2022.02.02. 00:00 | 12 |
| 2022.02.02. 00:15 | 12 |
| 2022.02.02. 00:30 | 12 |
| 2022.02.02. 00:45 | 12 |
| 2022.02.02. 01:00 | 12 |
| 2022.02.02. 01:15 | 12 |
| 2022.02.02. 01:30 | 12 |
| 2022.02.02. 01:45 | 12 |
| 2022.02.02. 02:00 | 12 |
| 2022.02.02. 02:15 | 12 |
| 2022.02.02. 02:30 | 12 |
| 2022.02.02. 02:45 | 12 |
| 2022.02.02. 03:00 | 12 |
| 2022.02.02. 03:15 | 12 |
| 2022.02.02. 03:30 | 12 |
| 2022.02.02. 03:45 | 12 |
| 2022.02.02. 04:00 | 12 |
| 2022.02.02. 04:15 | 12 |
| 2022.02.02. 04:30 | 12 |
| 2022.02.02. 04:45 | 12 |
| 2022.02.02. 05:00 | 12 |
| 2022.02.02. 05:15 | 12 |
| 2022.02.02. 05:30 | 12 |
| 2022.02.02. 05:45 | 12 |
| 2022.02.02. 06:00 | 12 |
| 2022.02.02. 06:15 | 12 |
| 2022.02.02. 06:30 | 12 |
| 2022.02.02. 06:45 | 12 |
| 2022.02.02. 07:00 | 12 |
| 2022.02.02. 07:15 | 12 |
| 2022.02.02. 07:30 | 12 |
| 2022.02.02. 07:45 | 12 |
| 2022.02.02. 08:00 | 12 |
| 2022.02.02. 08:15 | 12 |
| 2022.02.02. 08:30 | 12 |
| 2022.02.02. 08:45 | 12 |
| 2022.02.02. 09:00 | 12 |
| 2022.02.02. 09:15 | 12 |
| 2022.02.02. 09:30 | 12 |
| 2022.02.02. 09:45 | 12 |
| 2022.02.02. 10:00 | 12 |
| 2022.02.02. 10:15 | 12 |
| 2022.02.02. 10:30 | 12 |
| 2022.02.02. 10:45 | 12 |
| 2022.02.02. 11:00 | 12 |
| 2022.02.02. 11:15 | 12 |
| 2022.02.02. 11:30 | 12 |
| 2022.02.02. 11:45 | 12 |
| 2022.02.02. 12:00 | 12 |
| 2022.02.02. 12:15 | 12 |
| 2022.02.02. 12:30 | 12 |
| 2022.02.02. 12:45 | 12 |
| 2022.02.02. 13:00 | 12 |
| 2022.02.02. 13:15 | 12 |
| 2022.02.02. 13:30 | 12 |
| 2022.02.02. 13:45 | 12 |
| 2022.02.02. 14:00 | 12 |
| 2022.02.02. 14:15 | 12 |
| 2022.02.02. 14:30 | 12 |
| 2022.02.02. 14:45 | 12 |
| 2022.02.02. 15:00 | 12 |
| 2022.02.02. 15:15 | 12 |
| 2022.02.02. 15:30 | 12 |
| 2022.02.02. 15:45 | 12 |
| 2022.02.02. 16:00 | 12 |
| 2022.02.02. 16:15 | 12 |
| 2022.02.02. 16:30 | 12 |
| 2022.02.02. 16:45 | 12 |
| 2022.02.02. 17:00 | 12 |
| 2022.02.02. 17:15 | 12 |
| 2022.02.02. 17:30 | 12 |
| 2022.02.02. 17:45 | 12 |
| 2022.02.02. 18:00 | 12 |
| 2022.02.02. 18:15 | 12 |
| 2022.02.02. 18:30 | 12 |
| 2022.02.02. 18:45 | 12 |
| 2022.02.02. 19:00 | 12 |
| 2022.02.02. 19:15 | 12 |
| 2022.02.02. 19:30 | 12 |
| 2022.02.02. 19:45 | 12 |
| 2022.02.02. 20:00 | 12 |
| 2022.02.02. 20:15 | 12 |
| 2022.02.02. 20:30 | 12 |
| 2022.02.02. 20:45 | 12 |
| 2022.02.02. 21:00 | 12 |
| 2022.02.02. 21:15 | 12 |
| 2022.02.02. 21:30 | 12 |
| 2022.02.02. 21:45 | 12 |
| 2022.02.02. 22:00 | 12 |
| 2022.02.02. 22:15 | 12 |
| 2022.02.02. 22:30 | 12 |
| 2022.02.02. 22:45 | 12 |
| 2022.02.02. 23:00 | 12 |
| 2022.02.02. 23:15 | 12 |
| 2022.02.02. 23:30 | 12 |
| 2022.02.02. 23:45 | 12 |
| 2022.02.03. 00:00 | 12 |
| 2022.02.03. 00:15 | 12 |
| 2022.02.03. 00:30 | 12 |
| 2022.02.03. 00:45 | 12 |
| 2022.02.03. 01:00 | 12 |
| 2022.02.03. 01:15 | 12 |
| 2022.02.03. 01:30 | 12 |
| 2022.02.03. 01:45 | 12 |
| 2022.02.03. 02:00 | 12 |
| 2022.02.03. 02:15 | 12 |
| 2022.02.03. 02:30 | 12 |
| 2022.02.03. 02:45 | 12 |
| 2022.02.03. 03:00 | 12 |
| 2022.02.03. 03:15 | 12 |
| 2022.02.03. 03:30 | 12 |
| 2022.02.03. 03:45 | 12 |
| 2022.02.03. 04:00 | 12 |
| 2022.02.03. 04:15 | 12 |
| 2022.02.03. 04:30 | 12 |
| 2022.02.03. 04:45 | 12 |
| 2022.02.03. 05:00 | 12 |
| 2022.02.03. 05:15 | 12 |
| 2022.02.03. 05:30 | 12 |
| 2022.02.03. 05:45 | 12 |
| 2022.02.03. 06:00 | 12 |
| 2022.02.03. 06:15 | 12 |
| 2022.02.03. 06:30 | 12 |
| 2022.02.03. 06:45 | 12 |
| 2022.02.03. 07:00 | 12 |
| 2022.02.03. 07:15 | 12 |
| 2022.02.03. 07:30 | 12 |
| 2022.02.03. 07:45 | 12 |
| 2022.02.03. 08:00 | 12 |
| 2022.02.03. 08:15 | 12 |
| 2022.02.03. 08:30 | 12 |
| 2022.02.03. 08:45 | 12 |
| 2022.02.03. 09:00 | 12 |
| 2022.02.03. 09:15 | 12 |
| 2022.02.03. 09:30 | 12 |
| 2022.02.03. 09:45 | 12 |
| 2022.02.03. 10:00 | 12 |
| 2022.02.03. 10:15 | 12 |
| 2022.02.03. 10:30 | 12 |
| 2022.02.03. 10:45 | 12 |
| 2022.02.03. 11:00 | 12 |
| 2022.02.03. 11:15 | 12 |
| 2022.02.03. 11:30 | 12 |
| 2022.02.03. 11:45 | 12 |
| 2022.02.03. 12:00 | 12 |
| 2022.02.03. 12:15 | 12 |
| 2022.02.03. 12:30 | 12 |
| 2022.02.03. 12:45 | 12 |
| 2022.02.03. 13:00 | 12 |
| 2022.02.03. 13:15 | 12 |
| 2022.02.03. 13:30 | 12 |
| 2022.02.03. 13:45 | 12 |
| 2022.02.03. 14:00 | 12 |
| 2022.02.03. 14:15 | 12 |
| 2022.02.03. 14:30 | 12 |
| 2022.02.03. 14:45 | 12 |
| 2022.02.03. 15:00 | 12 |
| 2022.02.03. 15:15 | 12 |
| 2022.02.03. 15:30 | 12 |
| 2022.02.03. 15:45 | 12 |
| 2022.02.03. 16:00 | 12 |
| 2022.02.03. 16:15 | 12 |
| 2022.02.03. 16:30 | 12 |
| 2022.02.03. 16:45 | 12 |
| 2022.02.03. 17:00 | 12 |
| 2022.02.03. 17:15 | 12 |
| 2022.02.03. 17:30 | 12 |
| 2022.02.03. 17:45 | 12 |
| 2022.02.03. 18:00 | 12 |
| 2022.02.03. 18:15 | 12 |
| 2022.02.03. 18:30 | 12 |
| 2022.02.03. 18:45 | 12 |
| 2022.02.03. 19:00 | 12 |
| 2022.02.03. 19:15 | 12 |
| 2022.02.03. 19:30 | 12 |
| 2022.02.03. 19:45 | 12 |
| 2022.02.03. 20:00 | 12 |
| 2022.02.03. 20:15 | 12 |
| 2022.02.03. 20:30 | 12 |
| 2022.02.03. 20:45 | 12 |
| 2022.02.03. 21:00 | 12 |
| 2022.02.03. 21:15 | 12 |
| 2022.02.03. 21:30 | 12 |
| 2022.02.03. 21:45 | 12 |
| 2022.02.03. 22:00 | 12 |
| 2022.02.03. 22:15 | 12 |
| 2022.02.03. 22:30 | 12 |
| 2022.02.03. 22:45 | 12 |
| 2022.02.03. 23:00 | 12 |
| 2022.02.03. 23:15 | 12 |
| 2022.02.03. 23:30 | 12 |
| 2022.02.03. 23:45 | 12 |
| 2022.02.04. 00:00 | 12 |
| 2022.02.04. 00:15 | 12 |
| 2022.02.04. 00:30 | 12 |
| 2022.02.04. 00:45 | 12 |
| 2022.02.04. 01:00 | 12 |
| 2022.02.04. 01:15 | 12 |
| 2022.02.04. 01:30 | 12 |
| 2022.02.04. 01:45 | 12 |
| 2022.02.04. 02:00 | 12 |
| 2022.02.04. 02:15 | 12 |
| 2022.02.04. 02:30 | 12 |
| 2022.02.04. 02:45 | 12 |
| 2022.02.04. 03:00 | 12 |
| 2022.02.04. 03:15 | 12 |
| 2022.02.04. 03:30 | 12 |
| 2022.02.04. 03:45 | 12 |
| 2022.02.04. 04:00 | 12 |
| 2022.02.04. 04:15 | 12 |
| 2022.02.04. 04:30 | 12 |
| 2022.02.04. 04:45 | 12 |
| 2022.02.04. 05:00 | 12 |
| 2022.02.04. 05:15 | 12 |
| 2022.02.04. 05:30 | 12 |
| 2022.02.04. 05:45 | 12 |
| 2022.02.04. 06:00 | 12 |
| 2022.02.04. 06:15 | 12 |
| 2022.02.04. 06:30 | 12 |
| 2022.02.04. 06:45 | 12 |
| 2022.02.04. 07:00 | 12 |
| 2022.02.04. 07:15 | 12 |
| 2022.02.04. 07:30 | 12 |
| 2022.02.04. 07:45 | 12 |
| 2022.02.04. 08:00 | 12 |
| 2022.02.04. 08:15 | 12 |
| 2022.02.04. 08:30 | 12 |
| 2022.02.04. 08:45 | 12 |
| 2022.02.04. 09:00 | 12 |
| 2022.02.04. 09:15 | 12 |
| 2022.02.04. 09:30 | 12 |
| 2022.02.04. 09:45 | 12 |
| 2022.02.04. 10:00 | 12 |
| 2022.02.04. 10:15 | 12 |
| 2022.02.04. 10:30 | 12 |
| 2022.02.04. 10:45 | 12 |
| 2022.02.04. 11:00 | 12 |
| 2022.02.04. 11:15 | 12 |
| 2022.02.04. 11:30 | 12 |
| 2022.02.04. 11:45 | 12 |
| 2022.02.04. 12:00 | 12 |
| 2022.02.04. 12:15 | 12 |
| 2022.02.04. 12:30 | 12 |
| 2022.02.04. 12:45 | 12 |
| 2022.02.04. 13:00 | 12 |
| 2022.02.04. 13:15 | 12 |
| 2022.02.04. 13:30 | 12 |
| 2022.02.04. 13:45 | 12 |
| 2022.02.04. 14:00 | 12 |
| 2022.02.04. 14:15 | 12 |
| 2022.02.04. 14:30 | 12 |
| 2022.02.04. 14:45 | 12 |
| 2022.02.04. 15:00 | 12 |
| 2022.02.04. 15:15 | 12 |
| 2022.02.04. 15:30 | 12 |
| 2022.02.04. 15:45 | 12 |
| 2022.02.04. 16:00 | 12 |
| 2022.02.04. 16:15 | 12 |
| 2022.02.04. 16:30 | 12 |
| 2022.02.04. 16:45 | 12 |
| 2022.02.04. 17:00 | 12 |
| 2022.02.04. 17:15 | 12 |
| 2022.02.04. 17:30 | 12 |
| 2022.02.04. 17:45 | 12 |
| 2022.02.04. 18:00 | 12 |
| 2022.02.04. 18:15 | 12 |
| 2022.02.04. 18:30 | 12 |
| 2022.02.04. 18:45 | 12 |
| 2022.02.04. 19:00 | 12 |
| 2022.02.04. 19:15 | 12 |
| 2022.02.04. 19:30 | 12 |
| 2022.02.04. 19:45 | 12 |
| 2022.02.04. 20:00 | 12 |
| 2022.02.04. 20:15 | 12 |
| 2022.02.04. 20:30 | 12 |
| 2022.02.04. 20:45 | 12 |
| 2022.02.04. 21:00 | 12 |
| 2022.02.04. 21:15 | 12 |
| 2022.02.04. 21:30 | 12 |
| 2022.02.04. 21:45 | 12 |
| 2022.02.04. 22:00 | 12 |
| 2022.02.04. 22:15 | 12 |
| 2022.02.04. 22:30 | 12 |
| 2022.02.04. 22:45 | 12 |
| 2022.02.04. 23:00 | 12 |
| 2022.02.04. 23:15 | 12 |
| 2022.02.04. 23:30 | 12 |
| 2022.02.04. 23:45 | 12 |
| 2022.02.05. 00:00 | 12 |
| 2022.02.05. 00:15 | 12 |
| 2022.02.05. 00:30 | 12 |
| 2022.02.05. 00:45 | 12 |
| 2022.02.05. 01:00 | 12 |
| 2022.02.05. 01:15 | 12 |
| 2022.02.05. 01:30 | 12 |
| 2022.02.05. 01:45 | 12 |
| 2022.02.05. 02:00 | 12 |
| 2022.02.05. 02:15 | 12 |
| 2022.02.05. 02:30 | 12 |
| 2022.02.05. 02:45 | 12 |
| 2022.02.05. 03:00 | 12 |
| 2022.02.05. 03:15 | 12 |
| 2022.02.05. 03:30 | 12 |
| 2022.02.05. 03:45 | 12 |
| 2022.02.05. 04:00 | 12 |
| 2022.02.05. 04:15 | 12 |
| 2022.02.05. 04:30 | 12 |
| 2022.02.05. 04:45 | 12 |
| 2022.02.05. 05:00 | 12 |
| 2022.02.05. 05:15 | 12 |
| 2022.02.05. 05:30 | 12 |
| 2022.02.05. 05:45 | 12 |
| 2022.02.05. 06:00 | 12 |
| 2022.02.05. 06:15 | 12 |
| 2022.02.05. 06:30 | 12 |
| 2022.02.05. 06:45 | 12 |
| 2022.02.05. 07:00 | 12 |
| 2022.02.05. 07:15 | 12 |
| 2022.02.05. 07:30 | 12 |
| 2022.02.05. 07:45 | 12 |
| 2022.02.05. 08:00 | 12 |
| 2022.02.05. 08:15 | 12 |
| 2022.02.05. 08:30 | 12 |
| 2022.02.05. 08:45 | 12 |
| 2022.02.05. 09:00 | 12 |
| 2022.02.05. 09:15 | 12 |
| 2022.02.05. 09:30 | 12 |
| 2022.02.05. 09:45 | 12 |
| 2022.02.05. 10:00 | 12 |
| 2022.02.05. 10:15 | 12 |
| 2022.02.05. 10:30 | 12 |
| 2022.02.05. 10:45 | 12 |
| 2022.02.05. 11:00 | 12 |
| 2022.02.05. 11:15 | 12 |
| 2022.02.05. 11:30 | 12 |
| 2022.02.05. 11:45 | 12 |
| 2022.02.05. 12:00 | 12 |
| 2022.02.05. 12:15 | 12 |
| 2022.02.05. 12:30 | 12 |
| 2022.02.05. 12:45 | 12 |
| 2022.02.05. 13:00 | 12 |
| 2022.02.05. 13:15 | 12 |
| 2022.02.05. 13:30 | 12 |
| 2022.02.05. 13:45 | 12 |
| 2022.02.05. 14:00 | 12 |
| 2022.02.05. 14:15 | 12 |
| 2022.02.05. 14:30 | 12 |
| 2022.02.05. 14:45 | 12 |
| 2022.02.05. 15:00 | 12 |
| 2022.02.05. 15:15 | 12 |
| 2022.02.05. 15:30 | 12 |
| 2022.02.05. 15:45 | 12 |
| 2022.02.05. 16:00 | 12 |
| 2022.02.05. 16:15 | 12 |
| 2022.02.05. 16:30 | 12 |
| 2022.02.05. 16:45 | 12 |
| 2022.02.05. 17:00 | 12 |
| 2022.02.05. 17:15 | 12 |
| 2022.02.05. 17:30 | 12 |
| 2022.02.05. 17:45 | 12 |
| 2022.02.05. 18:00 | 12 |
| 2022.02.05. 18:15 | 12 |
| 2022.02.05. 18:30 | 12 |
| 2022.02.05. 18:45 | 12 |
| 2022.02.05. 19:00 | 12 |
| 2022.02.05. 19:15 | 12 |
| 2022.02.05. 19:30 | 12 |
| 2022.02.05. 19:45 | 12 |
| 2022.02.05. 20:00 | 12 |
| 2022.02.05. 20:15 | 12 |
| 2022.02.05. 20:30 | 12 |
| 2022.02.05. 20:45 | 12 |
| 2022.02.05. 21:00 | 12 |
| 2022.02.05. 21:15 | 12 |
| 2022.02.05. 21:30 | 12 |
| 2022.02.05. 21:45 | 12 |
| 2022.02.05. 22:00 | 12 |
| 2022.02.05. 22:15 | 12 |
| 2022.02.05. 22:30 | 12 |
| 2022.02.05. 22:45 | 12 |
| 2022.02.05. 23:00 | 12 |
| 2022.02.05. 23:15 | 12 |
| 2022.02.05. 23:30 | 12 |
| 2022.02.05. 23:45 | 12 |
| 2022.02.06. 00:00 | 12 |
| 2022.02.06. 00:15 | 12 |
| 2022.02.06. 00:30 | 12 |
| 2022.02.06. 00:45 | 12 |
| 2022.02.06. 01:00 | 12 |
| 2022.02.06. 01:15 | 12 |
| 2022.02.06. 01:30 | 12 |
| 2022.02.06. 01:45 | 12 |
| 2022.02.06. 02:00 | 12 |
| 2022.02.06. 02:15 | 12 |
| 2022.02.06. 02:30 | 12 |
| 2022.02.06. 02:45 | 12 |
| 2022.02.06. 03:00 | 12 |
| 2022.02.06. 03:15 | 12 |
| 2022.02.06. 03:30 | 12 |
| 2022.02.06. 03:45 | 12 |
| 2022.02.06. 04:00 | 12 |
| 2022.02.06. 04:15 | 12 |
| 2022.02.06. 04:30 | 12 |
| 2022.02.06. 04:45 | 12 |
| 2022.02.06. 05:00 | 12 |
| 2022.02.06. 05:15 | 12 |
| 2022.02.06. 05:30 | 12 |
| 2022.02.06. 05:45 | 12 |
| 2022.02.06. 06:00 | 12 |
| 2022.02.06. 06:15 | 12 |
| 2022.02.06. 06:30 | 12 |
| 2022.02.06. 06:45 | 12 |
| 2022.02.06. 07:00 | 12 |
| 2022.02.06. 07:15 | 12 |
| 2022.02.06. 07:30 | 12 |
| 2022.02.06. 07:45 | 12 |
| 2022.02.06. 08:00 | 12 |
| 2022.02.06. 08:15 | 12 |
| 2022.02.06. 08:30 | 12 |
| 2022.02.06. 08:45 | 12 |
| 2022.02.06. 09:00 | 12 |
| 2022.02.06. 09:15 | 12 |
| 2022.02.06. 09:30 | 12 |
| 2022.02.06. 09:45 | 12 |
| 2022.02.06. 10:00 | 12 |
| 2022.02.06. 10:15 | 12 |
| 2022.02.06. 10:30 | 12 |
| 2022.02.06. 10:45 | 12 |
| 2022.02.06. 11:00 | 12 |
| 2022.02.06. 11:15 | 12 |
| 2022.02.06. 11:30 | 12 |
| 2022.02.06. 11:45 | 12 |
| 2022.02.06. 12:00 | 12 |
| 2022.02.06. 12:15 | 12 |
| 2022.02.06. 12:30 | 12 |
| 2022.02.06. 12:45 | 12 |
| 2022.02.06. 13:00 | 12 |
| 2022.02.06. 13:15 | 12 |
| 2022.02.06. 13:30 | 12 |
| 2022.02.06. 13:45 | 12 |
| 2022.02.06. 14:00 | 12 |
| 2022.02.06. 14:15 | 12 |
| 2022.02.06. 14:30 | 12 |
| 2022.02.06. 14:45 | 12 |
| 2022.02.06. 15:00 | 12 |
| 2022.02.06. 15:15 | 12 |
| 2022.02.06. 15:30 | 12 |
| 2022.02.06. 15:45 | 12 |
| 2022.02.06. 16:00 | 12 |
| 2022.02.06. 16:15 | 12 |
| 2022.02.06. 16:30 | 12 |
| 2022.02.06. 16:45 | 12 |
| 2022.02.06. 17:00 | 12 |
| 2022.02.06. 17:15 | 12 |
| 2022.02.06. 17:30 | 12 |
| 2022.02.06. 17:45 | 12 |
| 2022.02.06. 18:00 | 12 |
| 2022.02.06. 18:15 | 12 |
| 2022.02.06. 18:30 | 12 |
| 2022.02.06. 18:45 | 12 |
| 2022.02.06. 19:00 | 12 |
| 2022.02.06. 19:15 | 12 |
| 2022.02.06. 19:30 | 12 |
| 2022.02.06. 19:45 | 12 |
| 2022.02.06. 20:00 | 12 |
| 2022.02.06. 20:15 | 12 |
| 2022.02.06. 20:30 | 12 |
| 2022.02.06. 20:45 | 12 |
| 2022.02.06. 21:00 | 12 |
| 2022.02.06. 21:15 | 12 |
| 2022.02.06. 21:30 | 12 |
| 2022.02.06. 21:45 | 12 |
| 2022.02.06. 22:00 | 12 |
| 2022.02.06. 22:15 | 12 |
| 2022.02.06. 22:30 | 12 |
| 2022.02.06. 22:45 | 12 |
| 2022.02.06. 23:00 | 12 |
| 2022.02.06. 23:15 | 12 |
| 2022.02.06. 23:30 | 12 |
| 2022.02.06. 23:45 | 12 |
| 2022.02.07. 00:00 | 12 |
| 2022.02.07. 00:15 | 12 |
| 2022.02.07. 00:30 | 12 |
| 2022.02.07. 00:45 | 12 |
| 2022.02.07. 01:00 | 12 |
| 2022.02.07. 01:15 | 12 |
| 2022.02.07. 01:30 | 12 |
| 2022.02.07. 01:45 | 12 |
| 2022.02.07. 02:00 | 12 |
| 2022.02.07. 02:15 | 12 |
| 2022.02.07. 02:30 | 12 |
| 2022.02.07. 02:45 | 12 |
| 2022.02.07. 03:00 | 12 |
| 2022.02.07. 03:15 | 12 |
| 2022.02.07. 03:30 | 12 |
| 2022.02.07. 03:45 | 12 |
| 2022.02.07. 04:00 | 12 |
| 2022.02.07. 04:15 | 12 |
| 2022.02.07. 04:30 | 12 |
| 2022.02.07. 04:45 | 12 |
| 2022.02.07. 05:00 | 12 |
| 2022.02.07. 05:15 | 12 |
| 2022.02.07. 05:30 | 12 |
| 2022.02.07. 05:45 | 12 |
| 2022.02.07. 06:00 | 12 |
| 2022.02.07. 06:15 | 12 |
| 2022.02.07. 06:30 | 12 |
| 2022.02.07. 06:45 | 12 |
| 2022.02.07. 07:00 | 12 |
| 2022.02.07. 07:15 | 12 |
| 2022.02.07. 07:30 | 12 |
| 2022.02.07. 07:45 | 12 |
| 2022.02.07. 08:00 | 12 |
| 2022.02.07. 08:15 | 12 |
| 2022.02.07. 08:30 | 12 |
| 2022.02.07. 08:45 | 12 |
| 2022.02.07. 09:00 | 12 |
| 2022.02.07. 09:15 | 12 |
| 2022.02.07. 09:30 | 12 |
| 2022.02.07. 09:45 | 12 |
| 2022.02.07. 10:00 | 12 |
| 2022.02.07. 10:15 | 12 |
| 2022.02.07. 10:30 | 12 |
| 2022.02.07. 10:45 | 12 |
| 2022.02.07. 11:00 | 12 |
| 2022.02.07. 11:15 | 12 |
| 2022.02.07. 11:30 | 12 |
| 2022.02.07. 11:45 | 12 |
| 2022.02.07. 12:00 | 12 |
| 2022.02.07. 12:15 | 12 |
| 2022.02.07. 12:30 | 12 |
| 2022.02.07. 12:45 | 12 |
| 2022.02.07. 13:00 | 12 |
| 2022.02.07. 13:15 | 12 |
| 2022.02.07. 13:30 | 12 |
| 2022.02.07. 13:45 | 12 |
| 2022.02.07. 14:00 | 12 |
| 2022.02.07. 14:15 | 12 |
| 2022.02.07. 14:30 | 12 |
| 2022.02.07. 14:45 | 12 |
| 2022.02.07. 15:00 | 12 |
| 2022.02.07. 15:15 | 12 |
| 2022.02.07. 15:30 | 12 |
| 2022.02.07. 15:45 | 12 |
| 2022.02.07. 16:00 | 12 |
| 2022.02.07. 16:15 | 12 |
| 2022.02.07. 16:30 | 12 |
| 2022.02.07. 16:45 | 12 |
| 2022.02.07. 17:00 | 12 |
| 2022.02.07. 17:15 | 12 |
| 2022.02.07. 17:30 | 12 |
| 2022.02.07. 17:45 | 12 |
| 2022.02.07. 18:00 | 12 |
| 2022.02.07. 18:15 | 12 |
| 2022.02.07. 18:30 | 12 |
| 2022.02.07. 18:45 | 12 |
| 2022.02.07. 19:00 | 12 |
| 2022.02.07. 19:15 | 12 |
| 2022.02.07. 19:30 | 12 |
| 2022.02.07. 19:45 | 12 |
| 2022.02.07. 20:00 | 12 |
| 2022.02.07. 20:15 | 12 |
| 2022.02.07. 20:30 | 12 |
| 2022.02.07. 20:45 | 12 |
| 2022.02.07. 21:00 | 12 |
| 2022.02.07. 21:15 | 12 |
| 2022.02.07. 21:30 | 12 |
| 2022.02.07. 21:45 | 12 |
| 2022.02.07. 22:00 | 12 |
| 2022.02.07. 22:15 | 12 |
| 2022.02.07. 22:30 | 12 |
| 2022.02.07. 22:45 | 12 |
| 2022.02.07. 23:00 | 12 |
| 2022.02.07. 23:15 | 12 |
| 2022.02.07. 23:30 | 12 |
| 2022.02.07. 23:45 | 12 |
| 2022.02.08. 00:00 | 12 |
| 2022.02.08. 00:15 | 12 |
| 2022.02.08. 00:30 | 12 |
| 2022.02.08. 00:45 | 12 |
| 2022.02.08. 01:00 | 12 |
| 2022.02.08. 01:15 | 12 |
| 2022.02.08. 01:30 | 12 |
| 2022.02.08. 01:45 | 12 |
| 2022.02.08. 02:00 | 12 |
| 2022.02.08. 02:15 | 12 |
| 2022.02.08. 02:30 | 12 |
| 2022.02.08. 02:45 | 12 |
| 2022.02.08. 03:00 | 12 |
| 2022.02.08. 03:15 | 12 |
| 2022.02.08. 03:30 | 12 |
| 2022.02.08. 03:45 | 12 |
| 2022.02.08. 04:00 | 12 |
| 2022.02.08. 04:15 | 12 |
| 2022.02.08. 04:30 | 12 |
| 2022.02.08. 04:45 | 12 |
| 2022.02.08. 05:00 | 12 |
| 2022.02.08. 05:15 | 12 |
| 2022.02.08. 05:30 | 12 |
| 2022.02.08. 05:45 | 12 |
| 2022.02.08. 06:00 | 12 |
| 2022.02.08. 06:15 | 12 |
| 2022.02.08. 06:30 | 12 |
| 2022.02.08. 06:45 | 12 |
| 2022.02.08. 07:00 | 12 |
| 2022.02.08. 07:15 | 12 |
| 2022.02.08. 07:30 | 12 |
| 2022.02.08. 07:45 | 12 |
| 2022.02.08. 08:00 | 12 |
| 2022.02.08. 08:15 | 12 |
| 2022.02.08. 08:30 | 12 |
| 2022.02.08. 08:45 | 12 |
| 2022.02.08. 09:00 | 12 |
| 2022.02.08. 09:15 | 12 |
| 2022.02.08. 09:30 | 12 |
| 2022.02.08. 09:45 | 12 |
| 2022.02.08. 10:00 | 12 |
| 2022.02.08. 10:15 | 12 |
| 2022.02.08. 10:30 | 12 |
| 2022.02.08. 10:45 | 12 |
| 2022.02.08. 11:00 | 12 |
| 2022.02.08. 11:15 | 12 |
| 2022.02.08. 11:30 | 12 |
| 2022.02.08. 11:45 | 12 |
| 2022.02.08. 12:00 | 12 |
| 2022.02.08. 12:15 | 12 |
| 2022.02.08. 12:30 | 12 |
| 2022.02.08. 12:45 | 12 |
| 2022.02.08. 13:00 | 12 |
| 2022.02.08. 13:15 | 12 |
| 2022.02.08. 13:30 | 12 |
| 2022.02.08. 13:45 | 12 |
| 2022.02.08. 14:00 | 12 |
| 2022.02.08. 14:15 | 12 |
| 2022.02.08. 14:30 | 12 |
| 2022.02.08. 14:45 | 12 |
| 2022.02.08. 15:00 | 12 |
| 2022.02.08. 15:15 | 12 |
| 2022.02.08. 15:30 | 12 |
| 2022.02.08. 15:45 | 12 |
| 2022.02.08. 16:00 | 12 |
| 2022.02.08. 16:15 | 12 |
| 2022.02.08. 16:30 | 12 |
| 2022.02.08. 16:45 | 12 |
| 2022.02.08. 17:00 | 12 |
| 2022.02.08. 17:15 | 12 |
| 2022.02.08. 17:30 | 12 |
| 2022.02.08. 17:45 | 12 |
| 2022.02.08. 18:00 | 12 |
| 2022.02.08. 18:15 | 12 |
| 2022.02.08. 18:30 | 12 |
| 2022.02.08. 18:45 | 12 |
| 2022.02.08. 19:00 | 12 |
| 2022.02.08. 19:15 | 12 |
| 2022.02.08. 19:30 | 12 |
| 2022.02.08. 19:45 | 12 |
| 2022.02.08. 20:00 | 12 |
| 2022.02.08. 20:15 | 12 |
| 2022.02.08. 20:30 | 12 |
| 2022.02.08. 20:45 | 12 |
| 2022.02.08. 21:00 | 12 |
| 2022.02.08. 21:15 | 12 |
| 2022.02.08. 21:30 | 12 |
| 2022.02.08. 21:45 | 12 |
| 2022.02.08. 22:00 | 12 |
| 2022.02.08. 22:15 | 12 |
| 2022.02.08. 22:30 | 12 |
| 2022.02.08. 22:45 | 12 |
| 2022.02.08. 23:00 | 12 |
| 2022.02.08. 23:15 | 12 |
| 2022.02.08. 23:30 | 12 |
| 2022.02.08. 23:45 | 12 |
| 2022.02.09. 00:00 | 12 |
| 2022.02.09. 00:15 | 12 |
| 2022.02.09. 00:30 | 12 |
| 2022.02.09. 00:45 | 12 |
| 2022.02.09. 01:00 | 12 |
| 2022.02.09. 01:15 | 12 |
| 2022.02.09. 01:30 | 12 |
| 2022.02.09. 01:45 | 12 |
| 2022.02.09. 02:00 | 12 |
| 2022.02.09. 02:15 | 12 |
| 2022.02.09. 02:30 | 12 |
| 2022.02.09. 02:45 | 12 |
| 2022.02.09. 03:00 | 12 |
| 2022.02.09. 03:15 | 12 |
| 2022.02.09. 03:30 | 12 |
| 2022.02.09. 03:45 | 12 |
| 2022.02.09. 04:00 | 12 |
| 2022.02.09. 04:15 | 12 |
| 2022.02.09. 04:30 | 12 |
| 2022.02.09. 04:45 | 12 |
| 2022.02.09. 05:00 | 12 |
| 2022.02.09. 05:15 | 12 |
| 2022.02.09. 05:30 | 12 |
| 2022.02.09. 05:45 | 12 |
| 2022.02.09. 06:00 | 12 |
| 2022.02.09. 06:15 | 12 |
| 2022.02.09. 06:30 | 12 |
| 2022.02.09. 06:45 | 12 |
| 2022.02.09. 07:00 | 12 |
| 2022.02.09. 07:15 | 12 |
| 2022.02.09. 07:30 | 12 |
| 2022.02.09. 07:45 | 12 |
| 2022.02.09. 08:00 | 12 |
| 2022.02.09. 08:15 | 12 |
| 2022.02.09. 08:30 | 12 |
| 2022.02.09. 08:45 | 12 |
| 2022.02.09. 09:00 | 12 |
| 2022.02.09. 09:15 | 12 |
| 2022.02.09. 09:30 | 12 |
| 2022.02.09. 09:45 | 12 |
| 2022.02.09. 10:00 | 12 |
| 2022.02.09. 10:15 | 12 |
| 2022.02.09. 10:30 | 12 |
| 2022.02.09. 10:45 | 12 |
| 2022.02.09. 11:00 | 12 |
| 2022.02.09. 11:15 | 12 |
| 2022.02.09. 11:30 | 12 |
| 2022.02.09. 11:45 | 12 |
| 2022.02.09. 12:00 | 12 |
| 2022.02.09. 12:15 | 12 |
| 2022.02.09. 12:30 | 12 |
| 2022.02.09. 12:45 | 12 |
| 2022.02.09. 13:00 | 12 |
| 2022.02.09. 13:15 | 12 |
| 2022.02.09. 13:30 | 12 |
| 2022.02.09. 13:45 | 12 |
| 2022.02.09. 14:00 | 12 |
| 2022.02.09. 14:15 | 12 |
| 2022.02.09. 14:30 | 12 |
| 2022.02.09. 14:45 | 12 |
| 2022.02.09. 15:00 | 12 |
| 2022.02.09. 15:15 | 12 |
| 2022.02.09. 15:30 | 12 |
| 2022.02.09. 15:45 | 12 |
| 2022.02.09. 16:00 | 12 |
| 2022.02.09. 16:15 | 12 |
| 2022.02.09. 16:30 | 12 |
| 2022.02.09. 16:45 | 12 |
| 2022.02.09. 17:00 | 12 |
| 2022.02.09. 17:15 | 12 |
| 2022.02.09. 17:30 | 12 |
| 2022.02.09. 17:45 | 12 |
| 2022.02.09. 18:00 | 12 |
| 2022.02.09. 18:15 | 12 |
| 2022.02.09. 18:30 | 12 |
| 2022.02.09. 18:45 | 12 |
| 2022.02.09. 19:00 | 12 |
| 2022.02.09. 19:15 | 12 |
| 2022.02.09. 19:30 | 12 |
| 2022.02.09. 19:45 | 12 |
| 2022.02.09. 20:00 | 12 |
| 2022.02.09. 20:15 | 12 |
| 2022.02.09. 20:30 | 12 |
| 2022.02.09. 20:45 | 12 |
| 2022.02.09. 21:00 | 12 |
| 2022.02.09. 21:15 | 12 |
| 2022.02.09. 21:30 | 12 |
| 2022.02.09. 21:45 | 12 |
| 2022.02.09. 22:00 | 12 |
| 2022.02.09. 22:15 | 12 |
| 2022.02.09. 22:30 | 12 |
| 2022.02.09. 22:45 | 12 |
| 2022.02.09. 23:00 | 12 |
| 2022.02.09. 23:15 | 12 |
| 2022.02.09. 23:30 | 12 |
| 2022.02.09. 23:45 | 12 |
| 2022.02.10. 00:00 | 12 |
| 2022.02.10. 00:15 | 12 |
| 2022.02.10. 00:30 | 12 |
| 2022.02.10. 00:45 | 12 |
| 2022.02.10. 01:00 | 12 |
| 2022.02.10. 01:15 | 12 |
| 2022.02.10. 01:30 | 12 |
| 2022.02.10. 01:45 | 12 |
| 2022.02.10. 02:00 | 12 |
| 2022.02.10. 02:15 | 12 |
| 2022.02.10. 02:30 | 12 |
| 2022.02.10. 02:45 | 12 |
| 2022.02.10. 03:00 | 12 |
| 2022.02.10. 03:15 | 12 |
| 2022.02.10. 03:30 | 12 |
| 2022.02.10. 03:45 | 12 |
| 2022.02.10. 04:00 | 12 |
| 2022.02.10. 04:15 | 12 |
| 2022.02.10. 04:30 | 12 |
| 2022.02.10. 04:45 | 12 |
| 2022.02.10. 05:00 | 12 |
| 2022.02.10. 05:15 | 12 |
| 2022.02.10. 05:30 | 12 |
| 2022.02.10. 05:45 | 12 |
| 2022.02.10. 06:00 | 12 |
| 2022.02.10. 06:15 | 12 |
| 2022.02.10. 06:30 | 12 |
| 2022.02.10. 06:45 | 12 |
| 2022.02.10. 07:00 | 12 |
| 2022.02.10. 07:15 | 12 |
| 2022.02.10. 07:30 | 12 |
| 2022.02.10. 07:45 | 12 |
| 2022.02.10. 08:00 | 12 |
| 2022.02.10. 08:15 | 12 |
| 2022.02.10. 08:30 | 12 |
| 2022.02.10. 08:45 | 12 |
| 2022.02.10. 09:00 | 12 |
| 2022.02.10. 09:15 | 12 |
| 2022.02.10. 09:30 | 12 |
| 2022.02.10. 09:45 | 12 |
| 2022.02.10. 10:00 | 12 |
| 2022.02.10. 10:15 | 12 |
| 2022.02.10. 10:30 | 12 |
| 2022.02.10. 10:45 | 12 |
| 2022.02.10. 11:00 | 12 |
| 2022.02.10. 11:15 | 12 |
| 2022.02.10. 11:30 | 12 |
| 2022.02.10. 11:45 | 12 |
| 2022.02.10. 12:00 | 12 |
| 2022.02.10. 12:15 | 12 |
| 2022.02.10. 12:30 | 12 |
| 2022.02.10. 12:45 | 12 |
| 2022.02.10. 13:00 | 12 |
| 2022.02.10. 13:15 | 12 |
| 2022.02.10. 13:30 | 12 |
| 2022.02.10. 13:45 | 12 |
| 2022.02.10. 14:00 | 12 |
| 2022.02.10. 14:15 | 12 |
| 2022.02.10. 14:30 | 12 |
| 2022.02.10. 14:45 | 12 |
| 2022.02.10. 15:00 | 12 |
| 2022.02.10. 15:15 | 12 |
| 2022.02.10. 15:30 | 12 |
| 2022.02.10. 15:45 | 12 |
| 2022.02.10. 16:00 | 12 |
| 2022.02.10. 16:15 | 12 |
| 2022.02.10. 16:30 | 12 |
| 2022.02.10. 16:45 | 12 |
| 2022.02.10. 17:00 | 12 |
| 2022.02.10. 17:15 | 12 |
| 2022.02.10. 17:30 | 12 |
| 2022.02.10. 17:45 | 12 |
| 2022.02.10. 18:00 | 12 |
| 2022.02.10. 18:15 | 12 |
| 2022.02.10. 18:30 | 12 |
| 2022.02.10. 18:45 | 12 |
| 2022.02.10. 19:00 | 12 |
| 2022.02.10. 19:15 | 12 |
| 2022.02.10. 19:30 | 12 |
| 2022.02.10. 19:45 | 12 |
| 2022.02.10. 20:00 | 12 |
| 2022.02.10. 20:15 | 12 |
| 2022.02.10. 20:30 | 12 |
| 2022.02.10. 20:45 | 12 |
| 2022.02.10. 21:00 | 12 |
| 2022.02.10. 21:15 | 12 |
| 2022.02.10. 21:30 | 12 |
| 2022.02.10. 21:45 | 12 |
| 2022.02.10. 22:00 | 12 |
| 2022.02.10. 22:15 | 12 |
| 2022.02.10. 22:30 | 12 |
| 2022.02.10. 22:45 | 12 |
| 2022.02.10. 23:00 | 12 |
| 2022.02.10. 23:15 | 12 |
| 2022.02.10. 23:30 | 12 |
| 2022.02.10. 23:45 | 12 |
| 2022.02.11. 00:00 | 12 |
| 2022.02.11. 00:15 | 12 |
| 2022.02.11. 00:30 | 12 |
| 2022.02.11. 00:45 | 12 |
| 2022.02.11. 01:00 | 12 |
| 2022.02.11. 01:15 | 12 |
| 2022.02.11. 01:30 | 12 |
| 2022.02.11. 01:45 | 12 |
| 2022.02.11. 02:00 | 12 |
| 2022.02.11. 02:15 | 12 |
| 2022.02.11. 02:30 | 12 |
| 2022.02.11. 02:45 | 12 |
| 2022.02.11. 03:00 | 12 |
| 2022.02.11. 03:15 | 12 |
| 2022.02.11. 03:30 | 12 |
| 2022.02.11. 03:45 | 12 |
| 2022.02.11. 04:00 | 12 |
| 2022.02.11. 04:15 | 12 |
| 2022.02.11. 04:30 | 12 |
| 2022.02.11. 04:45 | 12 |
| 2022.02.11. 05:00 | 12 |
| 2022.02.11. 05:15 | 12 |
| 2022.02.11. 05:30 | 12 |
| 2022.02.11. 05:45 | 12 |
| 2022.02.11. 06:00 | 12 |
| 2022.02.11. 06:15 | 12 |
| 2022.02.11. 06:30 | 12 |
| 2022.02.11. 06:45 | 12 |
| 2022.02.11. 07:00 | 12 |
| 2022.02.11. 07:15 | 12 |
| 2022.02.11. 07:30 | 12 |
| 2022.02.11. 07:45 | 12 |
| 2022.02.11. 08:00 | 12 |
| 2022.02.11. 08:15 | 12 |
| 2022.02.11. 08:30 | 12 |
| 2022.02.11. 08:45 | 12 |
| 2022.02.11. 09:00 | 12 |
| 2022.02.11. 09:15 | 12 |
| 2022.02.11. 09:30 | 12 |
| 2022.02.11. 09:45 | 12 |
| 2022.02.11. 10:00 | 12 |
| 2022.02.11. 10:15 | 12 |
| 2022.02.11. 10:30 | 12 |
| 2022.02.11. 10:45 | 12 |
| 2022.02.11. 11:00 | 12 |
| 2022.02.11. 11:15 | 12 |
| 2022.02.11. 11:30 | 12 |
| 2022.02.11. 11:45 | 12 |
| 2022.02.11. 12:00 | 12 |
| 2022.02.11. 12:15 | 12 |
| 2022.02.11. 12:30 | 12 |
| 2022.02.11. 12:45 | 12 |
| 2022.02.11. 13:00 | 12 |
| 2022.02.11. 13:15 | 12 |
| 2022.02.11. 13:30 | 12 |
| 2022.02.11. 13:45 | 12 |
| 2022.02.11. 14:00 | 12 |
| 2022.02.11. 14:15 | 12 |
| 2022.02.11. 14:30 | 12 |
| 2022.02.11. 14:45 | 12 |
| 2022.02.11. 15:00 | 12 |
| 2022.02.11. 15:15 | 12 |
| 2022.02.11. 15:30 | 12 |
| 2022.02.11. 15:45 | 12 |
| 2022.02.11. 16:00 | 12 |
| 2022.02.11. 16:15 | 12 |
| 2022.02.11. 16:30 | 12 |
| 2022.02.11. 16:45 | 12 |
| 2022.02.11. 17:00 | 12 |
| 2022.02.11. 17:15 | 12 |
| 2022.02.11. 17:30 | 12 |
| 2022.02.11. 17:45 | 12 |
| 2022.02.11. 18:00 | 12 |
| 2022.02.11. 18:15 | 12 |
| 2022.02.11. 18:30 | 12 |
| 2022.02.11. 18:45 | 12 |
| 2022.02.11. 19:00 | 12 |
| 2022.02.11. 19:15 | 12 |
| 2022.02.11. 19:30 | 12 |
| 2022.02.11. 19:45 | 12 |
| 2022.02.11. 20:00 | 12 |
| 2022.02.11. 20:15 | 12 |
| 2022.02.11. 20:30 | 12 |
| 2022.02.11. 20:45 | 12 |
| 2022.02.11. 21:00 | 12 |
| 2022.02.11. 21:15 | 12 |
| 2022.02.11. 21:30 | 12 |
| 2022.02.11. 21:45 | 12 |
| 2022.02.11. 22:00 | 12 |
| 2022.02.11. 22:15 | 12 |
| 2022.02.11. 22:30 | 12 |
| 2022.02.11. 22:45 | 12 |
| 2022.02.11. 23:00 | 12 |
| 2022.02.11. 23:15 | 12 |
| 2022.02.11. 23:30 | 12 |
| 2022.02.11. 23:45 | 12 |
| 2022.02.12. 00:00 | 12 |
| 2022.02.12. 00:15 | 12 |
| 2022.02.12. 00:30 | 12 |
| 2022.02.12. 00:45 | 12 |
| 2022.02.12. 01:00 | 12 |
| 2022.02.12. 01:15 | 12 |
| 2022.02.12. 01:30 | 12 |
| 2022.02.12. 01:45 | 12 |
| 2022.02.12. 02:00 | 12 |
| 2022.02.12. 02:15 | 12 |
| 2022.02.12. 02:30 | 12 |
| 2022.02.12. 02:45 | 12 |
| 2022.02.12. 03:00 | 12 |
| 2022.02.12. 03:15 | 12 |
| 2022.02.12. 03:30 | 12 |
| 2022.02.12. 03:45 | 12 |
| 2022.02.12. 04:00 | 12 |
| 2022.02.12. 04:15 | 12 |
| 2022.02.12. 04:30 | 12 |
| 2022.02.12. 04:45 | 12 |
| 2022.02.12. 05:00 | 12 |
| 2022.02.12. 05:15 | 12 |
| 2022.02.12. 05:30 | 12 |
| 2022.02.12. 05:45 | 12 |
| 2022.02.12. 06:00 | 12 |
| 2022.02.12. 06:15 | 12 |
| 2022.02.12. 06:30 | 12 |
| 2022.02.12. 06:45 | 12 |
| 2022.02.12. 07:00 | 12 |
| 2022.02.12. 07:15 | 12 |
| 2022.02.12. 07:30 | 12 |
| 2022.02.12. 07:45 | 12 |
| 2022.02.12. 08:00 | 12 |
| 2022.02.12. 08:15 | 12 |
| 2022.02.12. 08:30 | 12 |
| 2022.02.12. 08:45 | 12 |
| 2022.02.12. 09:00 | 12 |
| 2022.02.12. 09:15 | 12 |
| 2022.02.12. 09:30 | 12 |
| 2022.02.12. 09:45 | 12 |
| 2022.02.12. 10:00 | 12 |
| 2022.02.12. 10:15 | 12 |
| 2022.02.12. 10:30 | 12 |
| 2022.02.12. 10:45 | 12 |
| 2022.02.12. 11:00 | 12 |
| 2022.02.12. 11:15 | 12 |
| 2022.02.12. 11:30 | 12 |
| 2022.02.12. 11:45 | 12 |
| 2022.02.12. 12:00 | 12 |
| 2022.02.12. 12:15 | 12 |
| 2022.02.12. 12:30 | 12 |
| 2022.02.12. 12:45 | 12 |
| 2022.02.12. 13:00 | 12 |
| 2022.02.12. 13:15 | 12 |
| 2022.02.12. 13:30 | 12 |
| 2022.02.12. 13:45 | 12 |
| 2022.02.12. 14:00 | 12 |
| 2022.02.12. 14:15 | 12 |
| 2022.02.12. 14:30 | 12 |
| 2022.02.12. 14:45 | 12 |
| 2022.02.12. 15:00 | 12 |
| 2022.02.12. 15:15 | 12 |
| 2022.02.12. 15:30 | 12 |
| 2022.02.12. 15:45 | 12 |
| 2022.02.12. 16:00 | 12 |
| 2022.02.12. 16:15 | 12 |
| 2022.02.12. 16:30 | 12 |
| 2022.02.12. 16:45 | 12 |
| 2022.02.12. 17:00 | 12 |
| 2022.02.12. 17:15 | 12 |
| 2022.02.12. 17:30 | 12 |
| 2022.02.12. 17:45 | 12 |
| 2022.02.12. 18:00 | 12 |
| 2022.02.12. 18:15 | 12 |
| 2022.02.12. 18:30 | 12 |
| 2022.02.12. 18:45 | 12 |
| 2022.02.12. 19:00 | 12 |
| 2022.02.12. 19:15 | 12 |
| 2022.02.12. 19:30 | 12 |
| 2022.02.12. 19:45 | 12 |
| 2022.02.12. 20:00 | 12 |
| 2022.02.12. 20:15 | 12 |
| 2022.02.12. 20:30 | 12 |
| 2022.02.12. 20:45 | 12 |
| 2022.02.12. 21:00 | 12 |
| 2022.02.12. 21:15 | 12 |
| 2022.02.12. 21:30 | 12 |
| 2022.02.12. 21:45 | 12 |
| 2022.02.12. 22:00 | 12 |
| 2022.02.12. 22:15 | 12 |
| 2022.02.12. 22:30 | 12 |
| 2022.02.12. 22:45 | 12 |
| 2022.02.12. 23:00 | 12 |
| 2022.02.12. 23:15 | 12 |
| 2022.02.12. 23:30 | 12 |
| 2022.02.12. 23:45 | 12 |
| 2022.02.13. 00:00 | 12 |
| 2022.02.13. 00:15 | 12 |
| 2022.02.13. 00:30 | 12 |
| 2022.02.13. 00:45 | 12 |
| 2022.02.13. 01:00 | 12 |
| 2022.02.13. 01:15 | 12 |
| 2022.02.13. 01:30 | 12 |
| 2022.02.13. 01:45 | 12 |
| 2022.02.13. 02:00 | 12 |
| 2022.02.13. 02:15 | 12 |
| 2022.02.13. 02:30 | 12 |
| 2022.02.13. 02:45 | 12 |
| 2022.02.13. 03:00 | 12 |
| 2022.02.13. 03:15 | 12 |
| 2022.02.13. 03:30 | 12 |
| 2022.02.13. 03:45 | 12 |
| 2022.02.13. 04:00 | 12 |
| 2022.02.13. 04:15 | 12 |
| 2022.02.13. 04:30 | 12 |
| 2022.02.13. 04:45 | 12 |
| 2022.02.13. 05:00 | 12 |
| 2022.02.13. 05:15 | 12 |
| 2022.02.13. 05:30 | 12 |
| 2022.02.13. 05:45 | 12 |
| 2022.02.13. 06:00 | 12 |
| 2022.02.13. 06:15 | 12 |
| 2022.02.13. 06:30 | 12 |
| 2022.02.13. 06:45 | 12 |
| 2022.02.13. 07:00 | 12 |
| 2022.02.13. 07:15 | 12 |
| 2022.02.13. 07:30 | 12 |
| 2022.02.13. 07:45 | 12 |
| 2022.02.13. 08:00 | 12 |
| 2022.02.13. 08:15 | 12 |
| 2022.02.13. 08:30 | 12 |
| 2022.02.13. 08:45 | 12 |
| 2022.02.13. 09:00 | 12 |
| 2022.02.13. 09:15 | 12 |
| 2022.02.13. 09:30 | 12 |
| 2022.02.13. 09:45 | 12 |
| 2022.02.13. 10:00 | 12 |
| 2022.02.13. 10:15 | 12 |
| 2022.02.13. 10:30 | 12 |
| 2022.02.13. 10:45 | 12 |
| 2022.02.13. 11:00 | 12 |
| 2022.02.13. 11:15 | 12 |
| 2022.02.13. 11:30 | 12 |
| 2022.02.13. 11:45 | 12 |
| 2022.02.13. 12:00 | 12 |
| 2022.02.13. 12:15 | 12 |
| 2022.02.13. 12:30 | 12 |
| 2022.02.13. 12:45 | 12 |
| 2022.02.13. 13:00 | 12 |
| 2022.02.13. 13:15 | 12 |
| 2022.02.13. 13:30 | 12 |
| 2022.02.13. 13:45 | 12 |
| 2022.02.13. 14:00 | 12 |
| 2022.02.13. 14:15 | 12 |
| 2022.02.13. 14:30 | 12 |
| 2022.02.13. 14:45 | 12 |
| 2022.02.13. 15:00 | 12 |
| 2022.02.13. 15:15 | 12 |
| 2022.02.13. 15:30 | 12 |
| 2022.02.13. 15:45 | 12 |
| 2022.02.13. 16:00 | 12 |
| 2022.02.13. 16:15 | 12 |
| 2022.02.13. 16:30 | 12 |
| 2022.02.13. 16:45 | 12 |
| 2022.02.13. 17:00 | 12 |
| 2022.02.13. 17:15 | 12 |
| 2022.02.13. 17:30 | 12 |
| 2022.02.13. 17:45 | 12 |
| 2022.02.13. 18:00 | 12 |
| 2022.02.13. 18:15 | 12 |
| 2022.02.13. 18:30 | 12 |
| 2022.02.13. 18:45 | 12 |
| 2022.02.13. 19:00 | 12 |
| 2022.02.13. 19:15 | 12 |
| 2022.02.13. 19:30 | 12 |
| 2022.02.13. 19:45 | 12 |
| 2022.02.13. 20:00 | 12 |
| 2022.02.13. 20:15 | 12 |
| 2022.02.13. 20:30 | 12 |
| 2022.02.13. 20:45 | 12 |
| 2022.02.13. 21:00 | 12 |
| 2022.02.13. 21:15 | 12 |
| 2022.02.13. 21:30 | 12 |
| 2022.02.13. 21:45 | 12 |
| 2022.02.13. 22:00 | 12 |
| 2022.02.13. 22:15 | 12 |
| 2022.02.13. 22:30 | 12 |
| 2022.02.13. 22:45 | 12 |
| 2022.02.13. 23:00 | 12 |
| 2022.02.13. 23:15 | 12 |
| 2022.02.13. 23:30 | 12 |
| 2022.02.13. 23:45 | 12 |
| 2022.02.14. 00:00 | 12 |
| 2022.02.14. 00:15 | 12 |
| 2022.02.14. 00:30 | 12 |
| 2022.02.14. 00:45 | 12 |
| 2022.02.14. 01:00 | 12 |
| 2022.02.14. 01:15 | 12 |
| 2022.02.14. 01:30 | 12 |
| 2022.02.14. 01:45 | 12 |
| 2022.02.14. 02:00 | 12 |
| 2022.02.14. 02:15 | 12 |
| 2022.02.14. 02:30 | 12 |
| 2022.02.14. 02:45 | 12 |
| 2022.02.14. 03:00 | 12 |
| 2022.02.14. 03:15 | 12 |
| 2022.02.14. 03:30 | 12 |
| 2022.02.14. 03:45 | 12 |
| 2022.02.14. 04:00 | 12 |
| 2022.02.14. 04:15 | 12 |
| 2022.02.14. 04:30 | 12 |
| 2022.02.14. 04:45 | 12 |
| 2022.02.14. 05:00 | 12 |
| 2022.02.14. 05:15 | 12 |
| 2022.02.14. 05:30 | 12 |
| 2022.02.14. 05:45 | 12 |
| 2022.02.14. 06:00 | 12 |
| 2022.02.14. 06:15 | 12 |
| 2022.02.14. 06:30 | 12 |
| 2022.02.14. 06:45 | 12 |
| 2022.02.14. 07:00 | 12 |
| 2022.02.14. 07:15 | 12 |
| 2022.02.14. 07:30 | 12 |
| 2022.02.14. 07:45 | 12 |
| 2022.02.14. 08:00 | 12 |
| 2022.02.14. 08:15 | 12 |
| 2022.02.14. 08:30 | 12 |
| 2022.02.14. 08:45 | 12 |
| 2022.02.14. 09:00 | 12 |
| 2022.02.14. 09:15 | 12 |
| 2022.02.14. 09:30 | 12 |
| 2022.02.14. 09:45 | 12 |
| 2022.02.14. 10:00 | 12 |
| 2022.02.14. 10:15 | 12 |
| 2022.02.14. 10:30 | 12 |
| 2022.02.14. 10:45 | 12 |
| 2022.02.14. 11:00 | 12 |
| 2022.02.14. 11:15 | 12 |
| 2022.02.14. 11:30 | 12 |
| 2022.02.14. 11:45 | 12 |
| 2022.02.14. 12:00 | 12 |
| 2022.02.14. 12:15 | 12 |
| 2022.02.14. 12:30 | 12 |
| 2022.02.14. 12:45 | 12 |
| 2022.02.14. 13:00 | 12 |
| 2022.02.14. 13:15 | 12 |
| 2022.02.14. 13:30 | 12 |
| 2022.02.14. 13:45 | 12 |
| 2022.02.14. 14:00 | 12 |
| 2022.02.14. 14:15 | 12 |
| 2022.02.14. 14:30 | 12 |
| 2022.02.14. 14:45 | 12 |
| 2022.02.14. 15:00 | 12 |
| 2022.02.14. 15:15 | 12 |
| 2022.02.14. 15:30 | 12 |
| 2022.02.14. 15:45 | 12 |
| 2022.02.14. 16:00 | 12 |
| 2022.02.14. 16:15 | 12 |
| 2022.02.14. 16:30 | 12 |
| 2022.02.14. 16:45 | 12 |
| 2022.02.14. 17:00 | 12 |
| 2022.02.14. 17:15 | 12 |
| 2022.02.14. 17:30 | 12 |
| 2022.02.14. 17:45 | 12 |
| 2022.02.14. 18:00 | 12 |
| 2022.02.14. 18:15 | 12 |
| 2022.02.14. 18:30 | 12 |
| 2022.02.14. 18:45 | 12 |
| 2022.02.14. 19:00 | 12 |
| 2022.02.14. 19:15 | 12 |
| 2022.02.14. 19:30 | 12 |
| 2022.02.14. 19:45 | 12 |
| 2022.02.14. 20:00 | 12 |
| 2022.02.14. 20:15 | 12 |
| 2022.02.14. 20:30 | 12 |
| 2022.02.14. 20:45 | 12 |
| 2022.02.14. 21:00 | 12 |
| 2022.02.14. 21:15 | 12 |
| 2022.02.14. 21:30 | 12 |
| 2022.02.14. 21:45 | 12 |
| 2022.02.14. 22:00 | 12 |
| 2022.02.14. 22:15 | 12 |
| 2022.02.14. 22:30 | 12 |
| 2022.02.14. 22:45 | 12 |
| 2022.02.14. 23:00 | 12 |
| 2022.02.14. 23:15 | 12 |
| 2022.02.14. 23:30 | 12 |
| 2022.02.14. 23:45 | 12 |
| 2022.02.15. 00:00 | 12 |
| 2022.02.15. 00:15 | 12 |
| 2022.02.15. 00:30 | 12 |
| 2022.02.15. 00:45 | 12 |
| 2022.02.15. 01:00 | 12 |
| 2022.02.15. 01:15 | 12 |
| 2022.02.15. 01:30 | 12 |
| 2022.02.15. 01:45 | 12 |
| 2022.02.15. 02:00 | 12 |
| 2022.02.15. 02:15 | 12 |
| 2022.02.15. 02:30 | 12 |
| 2022.02.15. 02:45 | 12 |
| 2022.02.15. 03:00 | 12 |
| 2022.02.15. 03:15 | 12 |
| 2022.02.15. 03:30 | 12 |
| 2022.02.15. 03:45 | 12 |
| 2022.02.15. 04:00 | 12 |
| 2022.02.15. 04:15 | 12 |
| 2022.02.15. 04:30 | 12 |
| 2022.02.15. 04:45 | 12 |
| 2022.02.15. 05:00 | 12 |
| 2022.02.15. 05:15 | 12 |
| 2022.02.15. 05:30 | 12 |
| 2022.02.15. 05:45 | 12 |
| 2022.02.15. 06:00 | 12 |
| 2022.02.15. 06:15 | 12 |
| 2022.02.15. 06:30 | 12 |
| 2022.02.15. 06:45 | 12 |
| 2022.02.15. 07:00 | 12 |
| 2022.02.15. 07:15 | 12 |
| 2022.02.15. 07:30 | 12 |
| 2022.02.15. 07:45 | 12 |
| 2022.02.15. 08:00 | 12 |
| 2022.02.15. 08:15 | 12 |
| 2022.02.15. 08:30 | 12 |
| 2022.02.15. 08:45 | 12 |
| 2022.02.15. 09:00 | 12 |
| 2022.02.15. 09:15 | 12 |
| 2022.02.15. 09:30 | 12 |
| 2022.02.15. 09:45 | 12 |
| 2022.02.15. 10:00 | 12 |
| 2022.02.15. 10:15 | 12 |
| 2022.02.15. 10:30 | 12 |
| 2022.02.15. 10:45 | 12 |
| 2022.02.15. 11:00 | 12 |
| 2022.02.15. 11:15 | 12 |
| 2022.02.15. 11:30 | 12 |
| 2022.02.15. 11:45 | 12 |
| 2022.02.15. 12:00 | 12 |
| 2022.02.15. 12:15 | 12 |
| 2022.02.15. 12:30 | 12 |
| 2022.02.15. 12:45 | 12 |
| 2022.02.15. 13:00 | 12 |
| 2022.02.15. 13:15 | 12 |
| 2022.02.15. 13:30 | 12 |
| 2022.02.15. 13:45 | 12 |
| 2022.02.15. 14:00 | 12 |
| 2022.02.15. 14:15 | 12 |
| 2022.02.15. 14:30 | 12 |
| 2022.02.15. 14:45 | 12 |
| 2022.02.15. 15:00 | 12 |
| 2022.02.15. 15:15 | 12 |
| 2022.02.15. 15:30 | 12 |
| 2022.02.15. 15:45 | 12 |
| 2022.02.15. 16:00 | 12 |
| 2022.02.15. 16:15 | 12 |
| 2022.02.15. 16:30 | 12 |
| 2022.02.15. 16:45 | 12 |
| 2022.02.15. 17:00 | 12 |
| 2022.02.15. 17:15 | 12 |
| 2022.02.15. 17:30 | 12 |
| 2022.02.15. 17:45 | 12 |
| 2022.02.15. 18:00 | 12 |
| 2022.02.15. 18:15 | 12 |
| 2022.02.15. 18:30 | 12 |
| 2022.02.15. 18:45 | 12 |
| 2022.02.15. 19:00 | 12 |
| 2022.02.15. 19:15 | 12 |
| 2022.02.15. 19:30 | 12 |
| 2022.02.15. 19:45 | 12 |
| 2022.02.15. 20:00 | 12 |
| 2022.02.15. 20:15 | 12 |
| 2022.02.15. 20:30 | 12 |
| 2022.02.15. 20:45 | 12 |
| 2022.02.15. 21:00 | 12 |
| 2022.02.15. 21:15 | 12 |
| 2022.02.15. 21:30 | 12 |
| 2022.02.15. 21:45 | 12 |
| 2022.02.15. 22:00 | 12 |
| 2022.02.15. 22:15 | 12 |
| 2022.02.15. 22:30 | 12 |
| 2022.02.15. 22:45 | 12 |
| 2022.02.15. 23:00 | 12 |
| 2022.02.15. 23:15 | 12 |
| 2022.02.15. 23:30 | 12 |
| 2022.02.15. 23:45 | 12 |
| 2022.02.16. 00:00 | 12 |
| 2022.02.16. 00:15 | 12 |
| 2022.02.16. 00:30 | 12 |
| 2022.02.16. 00:45 | 12 |
| 2022.02.16. 01:00 | 12 |
| 2022.02.16. 01:15 | 12 |
| 2022.02.16. 01:30 | 12 |
| 2022.02.16. 01:45 | 12 |
| 2022.02.16. 02:00 | 12 |
| 2022.02.16. 02:15 | 12 |
| 2022.02.16. 02:30 | 12 |
| 2022.02.16. 02:45 | 12 |
| 2022.02.16. 03:00 | 12 |
| 2022.02.16. 03:15 | 12 |
| 2022.02.16. 03:30 | 12 |
| 2022.02.16. 03:45 | 12 |
| 2022.02.16. 04:00 | 12 |
| 2022.02.16. 04:15 | 12 |
| 2022.02.16. 04:30 | 12 |
| 2022.02.16. 04:45 | 12 |
| 2022.02.16. 05:00 | 12 |
| 2022.02.16. 05:15 | 12 |
| 2022.02.16. 05:30 | 12 |
| 2022.02.16. 05:45 | 12 |
| 2022.02.16. 06:00 | 12 |
| 2022.02.16. 06:15 | 12 |
| 2022.02.16. 06:30 | 12 |
| 2022.02.16. 06:45 | 12 |
| 2022.02.16. 07:00 | 12 |
| 2022.02.16. 07:15 | 12 |
| 2022.02.16. 07:30 | 12 |
| 2022.02.16. 07:45 | 12 |
| 2022.02.16. 08:00 | 12 |
| 2022.02.16. 08:15 | 12 |
| 2022.02.16. 08:30 | 12 |
| 2022.02.16. 08:45 | 12 |
| 2022.02.16. 09:00 | 12 |
| 2022.02.16. 09:15 | 12 |
| 2022.02.16. 09:30 | 12 |
| 2022.02.16. 09:45 | 12 |
| 2022.02.16. 10:00 | 12 |
| 2022.02.16. 10:15 | 12 |
| 2022.02.16. 10:30 | 12 |
| 2022.02.16. 10:45 | 12 |
| 2022.02.16. 11:00 | 12 |
| 2022.02.16. 11:15 | 12 |
| 2022.02.16. 11:30 | 12 |
| 2022.02.16. 11:45 | 12 |
| 2022.02.16. 12:00 | 12 |
| 2022.02.16. 12:15 | 12 |
| 2022.02.16. 12:30 | 12 |
| 2022.02.16. 12:45 | 12 |
| 2022.02.16. 13:00 | 12 |
| 2022.02.16. 13:15 | 12 |
| 2022.02.16. 13:30 | 12 |
| 2022.02.16. 13:45 | 12 |
| 2022.02.16. 14:00 | 12 |
| 2022.02.16. 14:15 | 12 |
| 2022.02.16. 14:30 | 12 |
| 2022.02.16. 14:45 | 12 |
| 2022.02.16. 15:00 | 12 |
| 2022.02.16. 15:15 | 12 |
| 2022.02.16. 15:30 | 12 |
| 2022.02.16. 15:45 | 12 |
| 2022.02.16. 16:00 | 12 |
| 2022.02.16. 16:15 | 12 |
| 2022.02.16. 16:30 | 12 |
| 2022.02.16. 16:45 | 12 |
| 2022.02.16. 17:00 | 12 |
| 2022.02.16. 17:15 | 12 |
| 2022.02.16. 17:30 | 12 |
| 2022.02.16. 17:45 | 12 |
| 2022.02.16. 18:00 | 12 |
| 2022.02.16. 18:15 | 12 |
| 2022.02.16. 18:30 | 12 |
| 2022.02.16. 18:45 | 12 |
| 2022.02.16. 19:00 | 12 |
| 2022.02.16. 19:15 | 12 |
| 2022.02.16. 19:30 | 12 |
| 2022.02.16. 19:45 | 12 |
| 2022.02.16. 20:00 | 12 |
| 2022.02.16. 20:15 | 12 |
| 2022.02.16. 20:30 | 12 |
| 2022.02.16. 20:45 | 12 |
| 2022.02.16. 21:00 | 12 |
| 2022.02.16. 21:15 | 12 |
| 2022.02.16. 21:30 | 12 |
| 2022.02.16. 21:45 | 12 |
| 2022.02.16. 22:00 | 12 |
| 2022.02.16. 22:15 | 12 |
| 2022.02.16. 22:30 | 12 |
| 2022.02.16. 22:45 | 12 |
| 2022.02.16. 23:00 | 12 |
| 2022.02.16. 23:15 | 12 |
| 2022.02.16. 23:30 | 12 |
| 2022.02.16. 23:45 | 12 |
| 2022.02.17. 00:00 | 12 |
| 2022.02.17. 00:15 | 12 |
| 2022.02.17. 00:30 | 12 |
| 2022.02.17. 00:45 | 12 |
| 2022.02.17. 01:00 | 12 |
| 2022.02.17. 01:15 | 12 |
| 2022.02.17. 01:30 | 12 |
| 2022.02.17. 01:45 | 12 |
| 2022.02.17. 02:00 | 12 |
| 2022.02.17. 02:15 | 12 |
| 2022.02.17. 02:30 | 12 |
| 2022.02.17. 02:45 | 12 |
| 2022.02.17. 03:00 | 12 |
| 2022.02.17. 03:15 | 12 |
| 2022.02.17. 03:30 | 12 |
| 2022.02.17. 03:45 | 12 |
| 2022.02.17. 04:00 | 12 |
| 2022.02.17. 04:15 | 12 |
| 2022.02.17. 04:30 | 12 |
| 2022.02.17. 04:45 | 12 |
| 2022.02.17. 05:00 | 12 |
| 2022.02.17. 05:15 | 12 |
| 2022.02.17. 05:30 | 12 |
| 2022.02.17. 05:45 | 12 |
| 2022.02.17. 06:00 | 12 |
| 2022.02.17. 06:15 | 12 |
| 2022.02.17. 06:30 | 12 |
| 2022.02.17. 06:45 | 12 |
| 2022.02.17. 07:00 | 12 |
| 2022.02.17. 07:15 | 12 |
| 2022.02.17. 07:30 | 12 |
| 2022.02.17. 07:45 | 12 |
| 2022.02.17. 08:00 | 12 |
| 2022.02.17. 08:15 | 12 |
| 2022.02.17. 08:30 | 12 |
| 2022.02.17. 08:45 | 12 |
| 2022.02.17. 09:00 | 12 |
| 2022.02.17. 09:15 | 12 |
| 2022.02.17. 09:30 | 12 |
| 2022.02.17. 09:45 | 12 |
| 2022.02.17. 10:00 | 12 |
| 2022.02.17. 10:15 | 12 |
| 2022.02.17. 10:30 | 12 |
| 2022.02.17. 10:45 | 12 |
| 2022.02.17. 11:00 | 12 |
| 2022.02.17. 11:15 | 12 |
| 2022.02.17. 11:30 | 12 |
| 2022.02.17. 11:45 | 12 |
| 2022.02.17. 12:00 | 12 |
| 2022.02.17. 12:15 | 12 |
| 2022.02.17. 12:30 | 12 |
| 2022.02.17. 12:45 | 12 |
| 2022.02.17. 13:00 | 12 |
| 2022.02.17. 13:15 | 12 |
| 2022.02.17. 13:30 | 12 |
| 2022.02.17. 13:45 | 12 |
| 2022.02.17. 14:00 | 12 |
| 2022.02.17. 14:15 | 12 |
| 2022.02.17. 14:30 | 12 |
| 2022.02.17. 14:45 | 12 |
| 2022.02.17. 15:00 | 12 |
| 2022.02.17. 15:15 | 12 |
| 2022.02.17. 15:30 | 12 |
| 2022.02.17. 15:45 | 12 |
| 2022.02.17. 16:00 | 12 |
| 2022.02.17. 16:15 | 12 |
| 2022.02.17. 16:30 | 12 |
| 2022.02.17. 16:45 | 12 |
| 2022.02.17. 17:00 | 12 |
| 2022.02.17. 17:15 | 12 |
| 2022.02.17. 17:30 | 12 |
| 2022.02.17. 17:45 | 12 |
| 2022.02.17. 18:00 | 12 |
| 2022.02.17. 18:15 | 12 |
| 2022.02.17. 18:30 | 12 |
| 2022.02.17. 18:45 | 12 |
| 2022.02.17. 19:00 | 12 |
| 2022.02.17. 19:15 | 12 |
| 2022.02.17. 19:30 | 12 |
| 2022.02.17. 19:45 | 12 |
| 2022.02.17. 20:00 | 12 |
| 2022.02.17. 20:15 | 12 |
| 2022.02.17. 20:30 | 12 |
| 2022.02.17. 20:45 | 12 |
| 2022.02.17. 21:00 | 12 |
| 2022.02.17. 21:15 | 12 |
| 2022.02.17. 21:30 | 12 |
| 2022.02.17. 21:45 | 12 |
| 2022.02.17. 22:00 | 12 |
| 2022.02.17. 22:15 | 12 |
| 2022.02.17. 22:30 | 12 |
| 2022.02.17. 22:45 | 12 |
| 2022.02.17. 23:00 | 12 |
| 2022.02.17. 23:15 | 12 |
| 2022.02.17. 23:30 | 12 |
| 2022.02.17. 23:45 | 12 |
| 2022.02.18. 00:00 | 12 |
| 2022.02.18. 00:15 | 12 |
| 2022.02.18. 00:30 | 12 |
| 2022.02.18. 00:45 | 12 |
| 2022.02.18. 01:00 | 12 |
| 2022.02.18. 01:15 | 12 |
| 2022.02.18. 01:30 | 12 |
| 2022.02.18. 01:45 | 12 |
| 2022.02.18. 02:00 | 12 |
| 2022.02.18. 02:15 | 12 |
| 2022.02.18. 02:30 | 12 |
| 2022.02.18. 02:45 | 12 |
| 2022.02.18. 03:00 | 12 |
| 2022.02.18. 03:15 | 12 |
| 2022.02.18. 03:30 | 12 |
| 2022.02.18. 03:45 | 12 |
| 2022.02.18. 04:00 | 12 |
| 2022.02.18. 04:15 | 12 |
| 2022.02.18. 04:30 | 12 |
| 2022.02.18. 04:45 | 12 |
| 2022.02.18. 05:00 | 12 |
| 2022.02.18. 05:15 | 12 |
| 2022.02.18. 05:30 | 12 |
| 2022.02.18. 05:45 | 12 |
| 2022.02.18. 06:00 | 12 |
| 2022.02.18. 06:15 | 12 |
| 2022.02.18. 06:30 | 12 |
| 2022.02.18. 06:45 | 12 |
| 2022.02.18. 07:00 | 12 |
| 2022.02.18. 07:15 | 12 |
| 2022.02.18. 07:30 | 12 |
| 2022.02.18. 07:45 | 12 |
| 2022.02.18. 08:00 | 12 |
| 2022.02.18. 08:15 | 12 |
| 2022.02.18. 08:30 | 12 |
| 2022.02.18. 08:45 | 12 |
| 2022.02.18. 09:00 | 12 |
| 2022.02.18. 09:15 | 12 |
| 2022.02.18. 09:30 | 12 |
| 2022.02.18. 09:45 | 12 |
| 2022.02.18. 10:00 | 12 |
| 2022.02.18. 10:15 | 12 |
| 2022.02.18. 10:30 | 12 |
| 2022.02.18. 10:45 | 12 |
| 2022.02.18. 11:00 | 12 |
| 2022.02.18. 11:15 | 12 |
| 2022.02.18. 11:30 | 12 |
| 2022.02.18. 11:45 | 12 |
| 2022.02.18. 12:00 | 12 |
| 2022.02.18. 12:15 | 12 |
| 2022.02.18. 12:30 | 12 |
| 2022.02.18. 12:45 | 12 |
| 2022.02.18. 13:00 | 12 |
| 2022.02.18. 13:15 | 12 |
| 2022.02.18. 13:30 | 12 |
| 2022.02.18. 13:45 | 12 |
| 2022.02.18. 14:00 | 12 |
| 2022.02.18. 14:15 | 12 |
| 2022.02.18. 14:30 | 12 |
| 2022.02.18. 14:45 | 12 |
| 2022.02.18. 15:00 | 12 |
| 2022.02.18. 15:15 | 12 |
| 2022.02.18. 15:30 | 12 |
| 2022.02.18. 15:45 | 12 |
| 2022.02.18. 16:00 | 12 |
| 2022.02.18. 16:15 | 12 |
| 2022.02.18. 16:30 | 12 |
| 2022.02.18. 16:45 | 12 |
| 2022.02.18. 17:00 | 12 |
| 2022.02.18. 17:15 | 12 |
| 2022.02.18. 17:30 | 12 |
| 2022.02.18. 17:45 | 12 |
| 2022.02.18. 18:00 | 12 |
| 2022.02.18. 18:15 | 12 |
| 2022.02.18. 18:30 | 12 |
| 2022.02.18. 18:45 | 12 |
| 2022.02.18. 19:00 | 12 |
| 2022.02.18. 19:15 | 12 |
| 2022.02.18. 19:30 | 12 |
| 2022.02.18. 19:45 | 12 |
| 2022.02.18. 20:00 | 12 |
| 2022.02.18. 20:15 | 12 |
| 2022.02.18. 20:30 | 12 |
| 2022.02.18. 20:45 | 12 |
| 2022.02.18. 21:00 | 12 |
| 2022.02.18. 21:15 | 12 |
| 2022.02.18. 21:30 | 12 |
| 2022.02.18. 21:45 | 12 |
| 2022.02.18. 22:00 | 12 |
| 2022.02.18. 22:15 | 12 |
| 2022.02.18. 22:30 | 12 |
| 2022.02.18. 22:45 | 12 |
| 2022.02.18. 23:00 | 12 |
| 2022.02.18. 23:15 | 12 |
| 2022.02.18. 23:30 | 12 |
| 2022.02.18. 23:45 | 12 |
| 2022.02.19. 00:00 | 12 |
| 2022.02.19. 00:15 | 12 |
| 2022.02.19. 00:30 | 12 |
| 2022.02.19. 00:45 | 12 |
| 2022.02.19. 01:00 | 12 |
| 2022.02.19. 01:15 | 12 |
| 2022.02.19. 01:30 | 12 |
| 2022.02.19. 01:45 | 12 |
| 2022.02.19. 02:00 | 12 |
| 2022.02.19. 02:15 | 12 |
| 2022.02.19. 02:30 | 12 |
| 2022.02.19. 02:45 | 12 |
| 2022.02.19. 03:00 | 12 |
| 2022.02.19. 03:15 | 12 |
| 2022.02.19. 03:30 | 12 |
| 2022.02.19. 03:45 | 12 |
| 2022.02.19. 04:00 | 12 |
| 2022.02.19. 04:15 | 12 |
| 2022.02.19. 04:30 | 12 |
| 2022.02.19. 04:45 | 12 |
| 2022.02.19. 05:00 | 12 |
| 2022.02.19. 05:15 | 12 |
| 2022.02.19. 05:30 | 12 |
| 2022.02.19. 05:45 | 12 |
| 2022.02.19. 06:00 | 12 |
| 2022.02.19. 06:15 | 12 |
| 2022.02.19. 06:30 | 12 |
| 2022.02.19. 06:45 | 12 |
| 2022.02.19. 07:00 | 12 |
| 2022.02.19. 07:15 | 12 |
| 2022.02.19. 07:30 | 12 |
| 2022.02.19. 07:45 | 12 |
| 2022.02.19. 08:00 | 12 |
| 2022.02.19. 08:15 | 12 |
| 2022.02.19. 08:30 | 12 |
| 2022.02.19. 08:45 | 12 |
| 2022.02.19. 09:00 | 12 |
| 2022.02.19. 09:15 | 12 |
| 2022.02.19. 09:30 | 12 |
| 2022.02.19. 09:45 | 12 |
| 2022.02.19. 10:00 | 12 |
| 2022.02.19. 10:15 | 12 |
| 2022.02.19. 10:30 | 12 |
| 2022.02.19. 10:45 | 12 |
| 2022.02.19. 11:00 | 12 |
| 2022.02.19. 11:15 | 12 |
| 2022.02.19. 11:30 | 12 |
| 2022.02.19. 11:45 | 12 |
| 2022.02.19. 12:00 | 12 |
| 2022.02.19. 12:15 | 12 |
| 2022.02.19. 12:30 | 12 |
| 2022.02.19. 12:45 | 12 |
| 2022.02.19. 13:00 | 12 |
| 2022.02.19. 13:15 | 12 |
| 2022.02.19. 13:30 | 12 |
| 2022.02.19. 13:45 | 12 |
| 2022.02.19. 14:00 | 12 |
| 2022.02.19. 14:15 | 12 |
| 2022.02.19. 14:30 | 12 |
| 2022.02.19. 14:45 | 12 |
| 2022.02.19. 15:00 | 12 |
| 2022.02.19. 15:15 | 12 |
| 2022.02.19. 15:30 | 12 |
| 2022.02.19. 15:45 | 12 |
| 2022.02.19. 16:00 | 12 |
| 2022.02.19. 16:15 | 12 |
| 2022.02.19. 16:30 | 12 |
| 2022.02.19. 16:45 | 12 |
| 2022.02.19. 17:00 | 12 |
| 2022.02.19. 17:15 | 12 |
| 2022.02.19. 17:30 | 12 |
| 2022.02.19. 17:45 | 12 |
| 2022.02.19. 18:00 | 12 |
| 2022.02.19. 18:15 | 12 |
| 2022.02.19. 18:30 | 12 |
| 2022.02.19. 18:45 | 12 |
| 2022.02.19. 19:00 | 12 |
| 2022.02.19. 19:15 | 12 |
| 2022.02.19. 19:30 | 12 |
| 2022.02.19. 19:45 | 12 |
| 2022.02.19. 20:00 | 12 |
| 2022.02.19. 20:15 | 12 |
| 2022.02.19. 20:30 | 12 |
| 2022.02.19. 20:45 | 12 |
| 2022.02.19. 21:00 | 12 |
| 2022.02.19. 21:15 | 12 |
| 2022.02.19. 21:30 | 12 |
| 2022.02.19. 21:45 | 12 |
| 2022.02.19. 22:00 | 12 |
| 2022.02.19. 22:15 | 12 |
| 2022.02.19. 22:30 | 12 |
| 2022.02.19. 22:45 | 12 |
| 2022.02.19. 23:00 | 12 |
| 2022.02.19. 23:15 | 12 |
| 2022.02.19. 23:30 | 12 |
| 2022.02.19. 23:45 | 12 |
| 2022.02.20. 00:00 | 12 |
| 2022.02.20. 00:15 | 12 |
| 2022.02.20. 00:30 | 12 |
| 2022.02.20. 00:45 | 12 |
| 2022.02.20. 01:00 | 12 |
| 2022.02.20. 01:15 | 12 |
| 2022.02.20. 01:30 | 12 |
| 2022.02.20. 01:45 | 12 |
| 2022.02.20. 02:00 | 12 |
| 2022.02.20. 02:15 | 12 |
| 2022.02.20. 02:30 | 12 |
| 2022.02.20. 02:45 | 12 |
| 2022.02.20. 03:00 | 12 |
| 2022.02.20. 03:15 | 12 |
| 2022.02.20. 03:30 | 12 |
| 2022.02.20. 03:45 | 12 |
| 2022.02.20. 04:00 | 12 |
| 2022.02.20. 04:15 | 12 |
| 2022.02.20. 04:30 | 12 |
| 2022.02.20. 04:45 | 12 |
| 2022.02.20. 05:00 | 12 |
| 2022.02.20. 05:15 | 12 |
| 2022.02.20. 05:30 | 12 |
| 2022.02.20. 05:45 | 12 |
| 2022.02.20. 06:00 | 12 |
| 2022.02.20. 06:15 | 12 |
| 2022.02.20. 06:30 | 12 |
| 2022.02.20. 06:45 | 12 |
| 2022.02.20. 07:00 | 12 |
| 2022.02.20. 07:15 | 12 |
| 2022.02.20. 07:30 | 12 |
| 2022.02.20. 07:45 | 12 |
| 2022.02.20. 08:00 | 12 |
| 2022.02.20. 08:15 | 12 |
| 2022.02.20. 08:30 | 12 |
| 2022.02.20. 08:45 | 12 |
| 2022.02.20. 09:00 | 12 |
| 2022.02.20. 09:15 | 12 |
| 2022.02.20. 09:30 | 12 |
| 2022.02.20. 09:45 | 12 |
| 2022.02.20. 10:00 | 12 |
| 2022.02.20. 10:15 | 12 |
| 2022.02.20. 10:30 | 12 |
| 2022.02.20. 10:45 | 12 |
| 2022.02.20. 11:00 | 12 |
| 2022.02.20. 11:15 | 12 |
| 2022.02.20. 11:30 | 12 |
| 2022.02.20. 11:45 | 12 |
| 2022.02.20. 12:00 | 12 |
| 2022.02.20. 12:15 | 12 |
| 2022.02.20. 12:30 | 12 |
| 2022.02.20. 12:45 | 12 |
| 2022.02.20. 13:00 | 12 |
| 2022.02.20. 13:15 | 12 |
| 2022.02.20. 13:30 | 12 |
| 2022.02.20. 13:45 | 12 |
| 2022.02.20. 14:00 | 12 |
| 2022.02.20. 14:15 | 12 |
| 2022.02.20. 14:30 | 12 |
| 2022.02.20. 14:45 | 12 |
| 2022.02.20. 15:00 | 12 |
| 2022.02.20. 15:15 | 12 |
| 2022.02.20. 15:30 | 12 |
| 2022.02.20. 15:45 | 12 |
| 2022.02.20. 16:00 | 12 |
| 2022.02.20. 16:15 | 12 |
| 2022.02.20. 16:30 | 12 |
| 2022.02.20. 16:45 | 12 |
| 2022.02.20. 17:00 | 12 |
| 2022.02.20. 17:15 | 12 |
| 2022.02.20. 17:30 | 12 |
| 2022.02.20. 17:45 | 12 |
| 2022.02.20. 18:00 | 12 |
| 2022.02.20. 18:15 | 12 |
| 2022.02.20. 18:30 | 12 |
| 2022.02.20. 18:45 | 12 |
| 2022.02.20. 19:00 | 12 |
| 2022.02.20. 19:15 | 12 |
| 2022.02.20. 19:30 | 12 |
| 2022.02.20. 19:45 | 12 |
| 2022.02.20. 20:00 | 12 |
| 2022.02.20. 20:15 | 12 |
| 2022.02.20. 20:30 | 12 |
| 2022.02.20. 20:45 | 12 |
| 2022.02.20. 21:00 | 12 |
| 2022.02.20. 21:15 | 12 |
| 2022.02.20. 21:30 | 12 |
| 2022.02.20. 21:45 | 12 |
| 2022.02.20. 22:00 | 12 |
| 2022.02.20. 22:15 | 12 |
| 2022.02.20. 22:30 | 12 |
| 2022.02.20. 22:45 | 12 |
| 2022.02.20. 23:00 | 12 |
| 2022.02.20. 23:15 | 12 |
| 2022.02.20. 23:30 | 12 |
| 2022.02.20. 23:45 | 12 |
| 2022.02.21. 00:00 | 12 |
| 2022.02.21. 00:15 | 12 |
| 2022.02.21. 00:30 | 12 |
| 2022.02.21. 00:45 | 12 |
| 2022.02.21. 01:00 | 12 |
| 2022.02.21. 01:15 | 12 |
| 2022.02.21. 01:30 | 12 |
| 2022.02.21. 01:45 | 12 |
| 2022.02.21. 02:00 | 12 |
| 2022.02.21. 02:15 | 12 |
| 2022.02.21. 02:30 | 12 |
| 2022.02.21. 02:45 | 12 |
| 2022.02.21. 03:00 | 12 |
| 2022.02.21. 03:15 | 12 |
| 2022.02.21. 03:30 | 12 |
| 2022.02.21. 03:45 | 12 |
| 2022.02.21. 04:00 | 12 |
| 2022.02.21. 04:15 | 12 |
| 2022.02.21. 04:30 | 12 |
| 2022.02.21. 04:45 | 12 |
| 2022.02.21. 05:00 | 12 |
| 2022.02.21. 05:15 | 12 |
| 2022.02.21. 05:30 | 12 |
| 2022.02.21. 05:45 | 12 |
| 2022.02.21. 06:00 | 12 |
| 2022.02.21. 06:15 | 12 |
| 2022.02.21. 06:30 | 12 |
| 2022.02.21. 06:45 | 12 |
| 2022.02.21. 07:00 | 12 |
| 2022.02.21. 07:15 | 12 |
| 2022.02.21. 07:30 | 12 |
| 2022.02.21. 07:45 | 12 |
| 2022.02.21. 08:00 | 12 |
| 2022.02.21. 08:15 | 12 |
| 2022.02.21. 08:30 | 12 |
| 2022.02.21. 08:45 | 12 |
| 2022.02.21. 09:00 | 12 |
| 2022.02.21. 09:15 | 12 |
| 2022.02.21. 09:30 | 12 |
| 2022.02.21. 09:45 | 12 |
| 2022.02.21. 10:00 | 12 |
| 2022.02.21. 10:15 | 12 |
| 2022.02.21. 10:30 | 12 |
| 2022.02.21. 10:45 | 12 |
| 2022.02.21. 11:00 | 12 |
| 2022.02.21. 11:15 | 12 |
| 2022.02.21. 11:30 | 12 |
| 2022.02.21. 11:45 | 12 |
| 2022.02.21. 12:00 | 12 |
| 2022.02.21. 12:15 | 12 |
| 2022.02.21. 12:30 | 12 |
| 2022.02.21. 12:45 | 12 |
| 2022.02.21. 13:00 | 12 |
| 2022.02.21. 13:15 | 12 |
| 2022.02.21. 13:30 | 12 |
| 2022.02.21. 13:45 | 12 |
| 2022.02.21. 14:00 | 12 |
| 2022.02.21. 14:15 | 12 |
| 2022.02.21. 14:30 | 12 |
| 2022.02.21. 14:45 | 12 |
| 2022.02.21. 15:00 | 12 |
| 2022.02.21. 15:15 | 12 |
| 2022.02.21. 15:30 | 12 |
| 2022.02.21. 15:45 | 12 |
| 2022.02.21. 16:00 | 12 |
| 2022.02.21. 16:15 | 12 |
| 2022.02.21. 16:30 | 12 |
| 2022.02.21. 16:45 | 12 |
| 2022.02.21. 17:00 | 12 |
| 2022.02.21. 17:15 | 12 |
| 2022.02.21. 17:30 | 12 |
| 2022.02.21. 17:45 | 12 |
| 2022.02.21. 18:00 | 12 |
| 2022.02.21. 18:15 | 12 |
| 2022.02.21. 18:30 | 12 |
| 2022.02.21. 18:45 | 12 |
| 2022.02.21. 19:00 | 12 |
| 2022.02.21. 19:15 | 12 |
| 2022.02.21. 19:30 | 12 |
| 2022.02.21. 19:45 | 12 |
| 2022.02.21. 20:00 | 12 |
| 2022.02.21. 20:15 | 12 |
| 2022.02.21. 20:30 | 12 |
| 2022.02.21. 20:45 | 12 |
| 2022.02.21. 21:00 | 12 |
| 2022.02.21. 21:15 | 12 |
| 2022.02.21. 21:30 | 12 |
| 2022.02.21. 21:45 | 12 |
| 2022.02.21. 22:00 | 12 |
| 2022.02.21. 22:15 | 12 |
| 2022.02.21. 22:30 | 12 |
| 2022.02.21. 22:45 | 12 |
| 2022.02.21. 23:00 | 12 |
| 2022.02.21. 23:15 | 12 |
| 2022.02.21. 23:30 | 12 |
| 2022.02.21. 23:45 | 12 |
| 2022.02.22. 00:00 | 12 |
| 2022.02.22. 00:15 | 12 |
| 2022.02.22. 00:30 | 12 |
| 2022.02.22. 00:45 | 12 |
| 2022.02.22. 01:00 | 12 |
| 2022.02.22. 01:15 | 12 |
| 2022.02.22. 01:30 | 12 |
| 2022.02.22. 01:45 | 12 |
| 2022.02.22. 02:00 | 12 |
| 2022.02.22. 02:15 | 12 |
| 2022.02.22. 02:30 | 12 |
| 2022.02.22. 02:45 | 12 |
| 2022.02.22. 03:00 | 12 |
| 2022.02.22. 03:15 | 12 |
| 2022.02.22. 03:30 | 12 |
| 2022.02.22. 03:45 | 12 |
| 2022.02.22. 04:00 | 12 |
| 2022.02.22. 04:15 | 12 |
| 2022.02.22. 04:30 | 12 |
| 2022.02.22. 04:45 | 12 |
| 2022.02.22. 05:00 | 12 |
| 2022.02.22. 05:15 | 12 |
| 2022.02.22. 05:30 | 12 |
| 2022.02.22. 05:45 | 12 |
| 2022.02.22. 06:00 | 12 |
| 2022.02.22. 06:15 | 12 |
| 2022.02.22. 06:30 | 12 |
| 2022.02.22. 06:45 | 12 |
| 2022.02.22. 07:00 | 12 |
| 2022.02.22. 07:15 | 12 |
| 2022.02.22. 07:30 | 12 |
| 2022.02.22. 07:45 | 12 |
| 2022.02.22. 08:00 | 12 |
| 2022.02.22. 08:15 | 12 |
| 2022.02.22. 08:30 | 12 |
| 2022.02.22. 08:45 | 12 |
| 2022.02.22. 09:00 | 12 |
| 2022.02.22. 09:15 | 12 |
| 2022.02.22. 09:30 | 12 |
| 2022.02.22. 09:45 | 12 |
| 2022.02.22. 10:00 | 12 |
| 2022.02.22. 10:15 | 12 |
| 2022.02.22. 10:30 | 12 |
| 2022.02.22. 10:45 | 12 |
| 2022.02.22. 11:00 | 12 |
| 2022.02.22. 11:15 | 12 |
| 2022.02.22. 11:30 | 12 |
| 2022.02.22. 11:45 | 12 |
| 2022.02.22. 12:00 | 12 |
| 2022.02.22. 12:15 | 12 |
| 2022.02.22. 12:30 | 12 |
| 2022.02.22. 12:45 | 12 |
| 2022.02.22. 13:00 | 12 |
| 2022.02.22. 13:15 | 12 |
| 2022.02.22. 13:30 | 12 |
| 2022.02.22. 13:45 | 12 |
| 2022.02.22. 14:00 | 12 |
| 2022.02.22. 14:15 | 12 |
| 2022.02.22. 14:30 | 12 |
| 2022.02.22. 14:45 | 12 |
| 2022.02.22. 15:00 | 12 |
| 2022.02.22. 15:15 | 12 |
| 2022.02.22. 15:30 | 12 |
| 2022.02.22. 15:45 | 12 |
| 2022.02.22. 16:00 | 12 |
| 2022.02.22. 16:15 | 12 |
| 2022.02.22. 16:30 | 12 |
| 2022.02.22. 16:45 | 12 |
| 2022.02.22. 17:00 | 12 |
| 2022.02.22. 17:15 | 12 |
| 2022.02.22. 17:30 | 12 |
| 2022.02.22. 17:45 | 12 |
| 2022.02.22. 18:00 | 12 |
| 2022.02.22. 18:15 | 12 |
| 2022.02.22. 18:30 | 12 |
| 2022.02.22. 18:45 | 12 |
| 2022.02.22. 19:00 | 12 |
| 2022.02.22. 19:15 | 12 |
| 2022.02.22. 19:30 | 12 |
| 2022.02.22. 19:45 | 12 |
| 2022.02.22. 20:00 | 12 |
| 2022.02.22. 20:15 | 12 |
| 2022.02.22. 20:30 | 12 |
| 2022.02.22. 20:45 | 12 |
| 2022.02.22. 21:00 | 12 |
| 2022.02.22. 21:15 | 12 |
| 2022.02.22. 21:30 | 12 |
| 2022.02.22. 21:45 | 12 |
| 2022.02.22. 22:00 | 12 |
| 2022.02.22. 22:15 | 12 |
| 2022.02.22. 22:30 | 12 |
| 2022.02.22. 22:45 | 12 |
| 2022.02.22. 23:00 | 12 |
| 2022.02.22. 23:15 | 12 |
| 2022.02.22. 23:30 | 12 |
| 2022.02.22. 23:45 | 12 |
| 2022.02.23. 00:00 | 12 |
| 2022.02.23. 00:15 | 12 |
| 2022.02.23. 00:30 | 12 |
| 2022.02.23. 00:45 | 12 |
| 2022.02.23. 01:00 | 12 |
| 2022.02.23. 01:15 | 12 |
| 2022.02.23. 01:30 | 12 |
| 2022.02.23. 01:45 | 12 |
| 2022.02.23. 02:00 | 12 |
| 2022.02.23. 02:15 | 12 |
| 2022.02.23. 02:30 | 12 |
| 2022.02.23. 02:45 | 12 |
| 2022.02.23. 03:00 | 12 |
| 2022.02.23. 03:15 | 12 |
| 2022.02.23. 03:30 | 12 |
| 2022.02.23. 03:45 | 12 |
| 2022.02.23. 04:00 | 12 |
| 2022.02.23. 04:15 | 12 |
| 2022.02.23. 04:30 | 12 |
| 2022.02.23. 04:45 | 12 |
| 2022.02.23. 05:00 | 12 |
| 2022.02.23. 05:15 | 12 |
| 2022.02.23. 05:30 | 12 |
| 2022.02.23. 05:45 | 12 |
| 2022.02.23. 06:00 | 12 |
| 2022.02.23. 06:15 | 12 |
| 2022.02.23. 06:30 | 12 |
| 2022.02.23. 06:45 | 12 |
| 2022.02.23. 07:00 | 12 |
| 2022.02.23. 07:15 | 12 |
| 2022.02.23. 07:30 | 12 |
| 2022.02.23. 07:45 | 12 |
| 2022.02.23. 08:00 | 12 |
| 2022.02.23. 08:15 | 12 |
| 2022.02.23. 08:30 | 12 |
| 2022.02.23. 08:45 | 12 |
| 2022.02.23. 09:00 | 12 |
| 2022.02.23. 09:15 | 12 |
| 2022.02.23. 09:30 | 12 |
| 2022.02.23. 09:45 | 12 |
| 2022.02.23. 10:00 | 12 |
| 2022.02.23. 10:15 | 12 |
| 2022.02.23. 10:30 | 12 |
| 2022.02.23. 10:45 | 12 |
| 2022.02.23. 11:00 | 12 |
| 2022.02.23. 11:15 | 12 |
| 2022.02.23. 11:30 | 12 |
| 2022.02.23. 11:45 | 12 |
| 2022.02.23. 12:00 | 12 |
| 2022.02.23. 12:15 | 12 |
| 2022.02.23. 12:30 | 12 |
| 2022.02.23. 12:45 | 12 |
| 2022.02.23. 13:00 | 12 |
| 2022.02.23. 13:15 | 12 |
| 2022.02.23. 13:30 | 12 |
| 2022.02.23. 13:45 | 12 |
| 2022.02.23. 14:00 | 12 |
| 2022.02.23. 14:15 | 12 |
| 2022.02.23. 14:30 | 12 |
| 2022.02.23. 14:45 | 12 |
| 2022.02.23. 15:00 | 12 |
| 2022.02.23. 15:15 | 12 |
| 2022.02.23. 15:30 | 12 |
| 2022.02.23. 15:45 | 12 |
| 2022.02.23. 16:00 | 12 |
| 2022.02.23. 16:15 | 12 |
| 2022.02.23. 16:30 | 12 |
| 2022.02.23. 16:45 | 12 |
| 2022.02.23. 17:00 | 12 |
| 2022.02.23. 17:15 | 12 |
| 2022.02.23. 17:30 | 12 |
| 2022.02.23. 17:45 | 12 |
| 2022.02.23. 18:00 | 12 |
| 2022.02.23. 18:15 | 12 |
| 2022.02.23. 18:30 | 12 |
| 2022.02.23. 18:45 | 12 |
| 2022.02.23. 19:00 | 12 |
| 2022.02.23. 19:15 | 12 |
| 2022.02.23. 19:30 | 12 |
| 2022.02.23. 19:45 | 12 |
| 2022.02.23. 20:00 | 12 |
| 2022.02.23. 20:15 | 12 |
| 2022.02.23. 20:30 | 12 |
| 2022.02.23. 20:45 | 12 |
| 2022.02.23. 21:00 | 12 |
| 2022.02.23. 21:15 | 12 |
| 2022.02.23. 21:30 | 12 |
| 2022.02.23. 21:45 | 12 |
| 2022.02.23. 22:00 | 12 |
| 2022.02.23. 22:15 | 12 |
| 2022.02.23. 22:30 | 12 |
| 2022.02.23. 22:45 | 12 |
| 2022.02.23. 23:00 | 12 |
| 2022.02.23. 23:15 | 12 |
| 2022.02.23. 23:30 | 12 |
| 2022.02.23. 23:45 | 12 |
| 2022.02.24. 00:00 | 12 |
| 2022.02.24. 00:15 | 12 |
| 2022.02.24. 00:30 | 12 |
| 2022.02.24. 00:45 | 12 |
| 2022.02.24. 01:00 | 12 |
| 2022.02.24. 01:15 | 12 |
| 2022.02.24. 01:30 | 12 |
| 2022.02.24. 01:45 | 12 |
| 2022.02.24. 02:00 | 12 |
| 2022.02.24. 02:15 | 12 |
| 2022.02.24. 02:30 | 12 |
| 2022.02.24. 02:45 | 12 |
| 2022.02.24. 03:00 | 12 |
| 2022.02.24. 03:15 | 12 |
| 2022.02.24. 03:30 | 12 |
| 2022.02.24. 03:45 | 12 |
| 2022.02.24. 04:00 | 12 |
| 2022.02.24. 04:15 | 12 |
| 2022.02.24. 04:30 | 12 |
| 2022.02.24. 04:45 | 12 |
| 2022.02.24. 05:00 | 12 |
| 2022.02.24. 05:15 | 12 |
| 2022.02.24. 05:30 | 12 |
| 2022.02.24. 05:45 | 12 |
| 2022.02.24. 06:00 | 12 |
| 2022.02.24. 06:15 | 12 |
| 2022.02.24. 06:30 | 12 |
| 2022.02.24. 06:45 | 12 |
| 2022.02.24. 07:00 | 12 |
| 2022.02.24. 07:15 | 12 |
| 2022.02.24. 07:30 | 12 |
| 2022.02.24. 07:45 | 12 |
| 2022.02.24. 08:00 | 12 |
| 2022.02.24. 08:15 | 12 |
| 2022.02.24. 08:30 | 12 |
| 2022.02.24. 08:45 | 12 |
| 2022.02.24. 09:00 | 12 |
| 2022.02.24. 09:15 | 12 |
| 2022.02.24. 09:30 | 12 |
| 2022.02.24. 09:45 | 12 |
| 2022.02.24. 10:00 | 12 |
| 2022.02.24. 10:15 | 12 |
| 2022.02.24. 10:30 | 12 |
| 2022.02.24. 10:45 | 12 |
| 2022.02.24. 11:00 | 12 |
| 2022.02.24. 11:15 | 12 |
| 2022.02.24. 11:30 | 12 |
| 2022.02.24. 11:45 | 12 |
| 2022.02.24. 12:00 | 12 |
| 2022.02.24. 12:15 | 12 |
| 2022.02.24. 12:30 | 12 |
| 2022.02.24. 12:45 | 12 |
| 2022.02.24. 13:00 | 12 |
| 2022.02.24. 13:15 | 12 |
| 2022.02.24. 13:30 | 12 |
| 2022.02.24. 13:45 | 12 |
| 2022.02.24. 14:00 | 12 |
| 2022.02.24. 14:15 | 12 |
| 2022.02.24. 14:30 | 12 |
| 2022.02.24. 14:45 | 12 |
| 2022.02.24. 15:00 | 12 |
| 2022.02.24. 15:15 | 12 |
| 2022.02.24. 15:30 | 12 |
| 2022.02.24. 15:45 | 12 |
| 2022.02.24. 16:00 | 12 |
| 2022.02.24. 16:15 | 12 |
| 2022.02.24. 16:30 | 12 |
| 2022.02.24. 16:45 | 12 |
| 2022.02.24. 17:00 | 12 |
| 2022.02.24. 17:15 | 12 |
| 2022.02.24. 17:30 | 12 |
| 2022.02.24. 17:45 | 12 |
| 2022.02.24. 18:00 | 12 |
| 2022.02.24. 18:15 | 12 |
| 2022.02.24. 18:30 | 12 |
| 2022.02.24. 18:45 | 12 |
| 2022.02.24. 19:00 | 12 |
| 2022.02.24. 19:15 | 12 |
| 2022.02.24. 19:30 | 12 |
| 2022.02.24. 19:45 | 12 |
| 2022.02.24. 20:00 | 12 |
| 2022.02.24. 20:15 | 12 |
| 2022.02.24. 20:30 | 12 |
| 2022.02.24. 20:45 | 12 |
| 2022.02.24. 21:00 | 12 |
| 2022.02.24. 21:15 | 12 |
| 2022.02.24. 21:30 | 12 |
| 2022.02.24. 21:45 | 12 |
| 2022.02.24. 22:00 | 12 |
| 2022.02.24. 22:15 | 12 |
| 2022.02.24. 22:30 | 12 |
| 2022.02.24. 22:45 | 12 |
| 2022.02.24. 23:00 | 12 |
| 2022.02.24. 23:15 | 12 |
| 2022.02.24. 23:30 | 12 |
| 2022.02.24. 23:45 | 12 |
| 2022.02.25. 00:00 | 12 |
| 2022.02.25. 00:15 | 12 |
| 2022.02.25. 00:30 | 12 |
| 2022.02.25. 00:45 | 12 |
| 2022.02.25. 01:00 | 12 |
| 2022.02.25. 01:15 | 12 |
| 2022.02.25. 01:30 | 12 |
| 2022.02.25. 01:45 | 12 |
| 2022.02.25. 02:00 | 12 |
| 2022.02.25. 02:15 | 12 |
| 2022.02.25. 02:30 | 12 |
| 2022.02.25. 02:45 | 12 |
| 2022.02.25. 03:00 | 12 |
| 2022.02.25. 03:15 | 12 |
| 2022.02.25. 03:30 | 12 |
| 2022.02.25. 03:45 | 12 |
| 2022.02.25. 04:00 | 12 |
| 2022.02.25. 04:15 | 12 |
| 2022.02.25. 04:30 | 12 |
| 2022.02.25. 04:45 | 12 |
| 2022.02.25. 05:00 | 12 |
| 2022.02.25. 05:15 | 12 |
| 2022.02.25. 05:30 | 12 |
| 2022.02.25. 05:45 | 12 |
| 2022.02.25. 06:00 | 12 |
| 2022.02.25. 06:15 | 12 |
| 2022.02.25. 06:30 | 12 |
| 2022.02.25. 06:45 | 12 |
| 2022.02.25. 07:00 | 12 |
| 2022.02.25. 07:15 | 12 |
| 2022.02.25. 07:30 | 12 |
| 2022.02.25. 07:45 | 12 |
| 2022.02.25. 08:00 | 12 |
| 2022.02.25. 08:15 | 12 |
| 2022.02.25. 08:30 | 12 |
| 2022.02.25. 08:45 | 12 |
| 2022.02.25. 09:00 | 12 |
| 2022.02.25. 09:15 | 12 |
| 2022.02.25. 09:30 | 12 |
| 2022.02.25. 09:45 | 12 |
| 2022.02.25. 10:00 | 12 |
| 2022.02.25. 10:15 | 12 |
| 2022.02.25. 10:30 | 12 |
| 2022.02.25. 10:45 | 12 |
| 2022.02.25. 11:00 | 12 |
| 2022.02.25. 11:15 | 12 |
| 2022.02.25. 11:30 | 12 |
| 2022.02.25. 11:45 | 12 |
| 2022.02.25. 12:00 | 12 |
| 2022.02.25. 12:15 | 12 |
| 2022.02.25. 12:30 | 12 |
| 2022.02.25. 12:45 | 12 |
| 2022.02.25. 13:00 | 12 |
| 2022.02.25. 13:15 | 12 |
| 2022.02.25. 13:30 | 12 |
| 2022.02.25. 13:45 | 12 |
| 2022.02.25. 14:00 | 12 |
| 2022.02.25. 14:15 | 12 |
| 2022.02.25. 14:30 | 12 |
| 2022.02.25. 14:45 | 12 |
| 2022.02.25. 15:00 | 12 |
| 2022.02.25. 15:15 | 12 |
| 2022.02.25. 15:30 | 12 |
| 2022.02.25. 15:45 | 12 |
| 2022.02.25. 16:00 | 12 |
| 2022.02.25. 16:15 | 12 |
| 2022.02.25. 16:30 | 12 |
| 2022.02.25. 16:45 | 12 |
| 2022.02.25. 17:00 | 12 |
| 2022.02.25. 17:15 | 12 |
| 2022.02.25. 17:30 | 12 |
| 2022.02.25. 17:45 | 12 |
| 2022.02.25. 18:00 | 12 |
| 2022.02.25. 18:15 | 12 |
| 2022.02.25. 18:30 | 12 |
| 2022.02.25. 18:45 | 12 |
| 2022.02.25. 19:00 | 12 |
| 2022.02.25. 19:15 | 12 |
| 2022.02.25. 19:30 | 12 |
| 2022.02.25. 19:45 | 12 |
| 2022.02.25. 20:00 | 12 |
| 2022.02.25. 20:15 | 12 |
| 2022.02.25. 20:30 | 12 |
| 2022.02.25. 20:45 | 12 |
| 2022.02.25. 21:00 | 12 |
| 2022.02.25. 21:15 | 12 |
| 2022.02.25. 21:30 | 12 |
| 2022.02.25. 21:45 | 12 |
| 2022.02.25. 22:00 | 12 |
| 2022.02.25. 22:15 | 12 |
| 2022.02.25. 22:30 | 12 |
| 2022.02.25. 22:45 | 12 |
| 2022.02.25. 23:00 | 12 |
| 2022.02.25. 23:15 | 12 |
| 2022.02.25. 23:30 | 12 |
| 2022.02.25. 23:45 | 12 |
| 2022.02.26. 00:00 | 12 |
| 2022.02.26. 00:15 | 12 |
| 2022.02.26. 00:30 | 12 |
| 2022.02.26. 00:45 | 12 |
| 2022.02.26. 01:00 | 12 |
| 2022.02.26. 01:15 | 12 |
| 2022.02.26. 01:30 | 12 |
| 2022.02.26. 01:45 | 12 |
| 2022.02.26. 02:00 | 12 |
| 2022.02.26. 02:15 | 12 |
| 2022.02.26. 02:30 | 12 |
| 2022.02.26. 02:45 | 12 |
| 2022.02.26. 03:00 | 12 |
| 2022.02.26. 03:15 | 12 |
| 2022.02.26. 03:30 | 12 |
| 2022.02.26. 03:45 | 12 |
| 2022.02.26. 04:00 | 12 |
| 2022.02.26. 04:15 | 12 |
| 2022.02.26. 04:30 | 12 |
| 2022.02.26. 04:45 | 12 |
| 2022.02.26. 05:00 | 12 |
| 2022.02.26. 05:15 | 12 |
| 2022.02.26. 05:30 | 12 |
| 2022.02.26. 05:45 | 12 |
| 2022.02.26. 06:00 | 12 |
| 2022.02.26. 06:15 | 12 |
| 2022.02.26. 06:30 | 12 |
| 2022.02.26. 06:45 | 12 |
| 2022.02.26. 07:00 | 12 |
| 2022.02.26. 07:15 | 12 |
| 2022.02.26. 07:30 | 12 |
| 2022.02.26. 07:45 | 12 |
| 2022.02.26. 08:00 | 12 |
| 2022.02.26. 08:15 | 12 |
| 2022.02.26. 08:30 | 12 |
| 2022.02.26. 08:45 | 12 |
| 2022.02.26. 09:00 | 12 |
| 2022.02.26. 09:15 | 12 |
| 2022.02.26. 09:30 | 12 |
| 2022.02.26. 09:45 | 12 |
| 2022.02.26. 10:00 | 12 |
| 2022.02.26. 10:15 | 12 |
| 2022.02.26. 10:30 | 12 |
| 2022.02.26. 10:45 | 12 |
| 2022.02.26. 11:00 | 12 |
| 2022.02.26. 11:15 | 12 |
| 2022.02.26. 11:30 | 12 |
| 2022.02.26. 11:45 | 12 |
| 2022.02.26. 12:00 | 12 |
| 2022.02.26. 12:15 | 12 |
| 2022.02.26. 12:30 | 12 |
| 2022.02.26. 12:45 | 12 |
| 2022.02.26. 13:00 | 12 |
| 2022.02.26. 13:15 | 12 |
| 2022.02.26. 13:30 | 12 |
| 2022.02.26. 13:45 | 12 |
| 2022.02.26. 14:00 | 12 |
| 2022.02.26. 14:15 | 12 |
| 2022.02.26. 14:30 | 12 |
| 2022.02.26. 14:45 | 12 |
| 2022.02.26. 15:00 | 12 |
| 2022.02.26. 15:15 | 12 |
| 2022.02.26. 15:30 | 12 |
| 2022.02.26. 15:45 | 12 |
| 2022.02.26. 16:00 | 12 |
| 2022.02.26. 16:15 | 12 |
| 2022.02.26. 16:30 | 12 |
| 2022.02.26. 16:45 | 12 |
| 2022.02.26. 17:00 | 12 |
| 2022.02.26. 17:15 | 12 |
| 2022.02.26. 17:30 | 12 |
| 2022.02.26. 17:45 | 12 |
| 2022.02.26. 18:00 | 12 |
| 2022.02.26. 18:15 | 12 |
| 2022.02.26. 18:30 | 12 |
| 2022.02.26. 18:45 | 12 |
| 2022.02.26. 19:00 | 12 |
| 2022.02.26. 19:15 | 12 |
| 2022.02.26. 19:30 | 12 |
| 2022.02.26. 19:45 | 12 |
| 2022.02.26. 20:00 | 12 |
| 2022.02.26. 20:15 | 12 |
| 2022.02.26. 20:30 | 12 |
| 2022.02.26. 20:45 | 12 |
| 2022.02.26. 21:00 | 12 |
| 2022.02.26. 21:15 | 12 |
| 2022.02.26. 21:30 | 12 |
| 2022.02.26. 21:45 | 12 |
| 2022.02.26. 22:00 | 12 |
| 2022.02.26. 22:15 | 12 |
| 2022.02.26. 22:30 | 12 |
| 2022.02.26. 22:45 | 12 |
| 2022.02.26. 23:00 | 12 |
| 2022.02.26. 23:15 | 12 |
| 2022.02.26. 23:30 | 12 |
| 2022.02.26. 23:45 | 12 |
| 2022.02.27. 00:00 | 12 |
| 2022.02.27. 00:15 | 12 |
| 2022.02.27. 00:30 | 12 |
| 2022.02.27. 00:45 | 12 |
| 2022.02.27. 01:00 | 12 |
| 2022.02.27. 01:15 | 12 |
| 2022.02.27. 01:30 | 12 |
| 2022.02.27. 01:45 | 12 |
| 2022.02.27. 02:00 | 12 |
| 2022.02.27. 02:15 | 12 |
| 2022.02.27. 02:30 | 12 |
| 2022.02.27. 02:45 | 12 |
| 2022.02.27. 03:00 | 12 |
| 2022.02.27. 03:15 | 12 |
| 2022.02.27. 03:30 | 12 |
| 2022.02.27. 03:45 | 12 |
| 2022.02.27. 04:00 | 12 |
| 2022.02.27. 04:15 | 12 |
| 2022.02.27. 04:30 | 12 |
| 2022.02.27. 04:45 | 12 |
| 2022.02.27. 05:00 | 12 |
| 2022.02.27. 05:15 | 12 |
| 2022.02.27. 05:30 | 12 |
| 2022.02.27. 05:45 | 12 |
| 2022.02.27. 06:00 | 12 |
| 2022.02.27. 06:15 | 12 |
| 2022.02.27. 06:30 | 12 |
| 2022.02.27. 06:45 | 12 |
| 2022.02.27. 07:00 | 12 |
| 2022.02.27. 07:15 | 12 |
| 2022.02.27. 07:30 | 12 |
| 2022.02.27. 07:45 | 12 |
| 2022.02.27. 08:00 | 12 |
| 2022.02.27. 08:15 | 12 |
| 2022.02.27. 08:30 | 12 |
| 2022.02.27. 08:45 | 12 |
| 2022.02.27. 09:00 | 12 |
| 2022.02.27. 09:15 | 12 |
| 2022.02.27. 09:30 | 12 |
| 2022.02.27. 09:45 | 12 |
| 2022.02.27. 10:00 | 12 |
| 2022.02.27. 10:15 | 12 |
| 2022.02.27. 10:30 | 12 |
| 2022.02.27. 10:45 | 12 |
| 2022.02.27. 11:00 | 12 |
| 2022.02.27. 11:15 | 12 |
| 2022.02.27. 11:30 | 12 |
| 2022.02.27. 11:45 | 12 |
| 2022.02.27. 12:00 | 12 |
| 2022.02.27. 12:15 | 12 |
| 2022.02.27. 12:30 | 12 |
| 2022.02.27. 12:45 | 12 |
| 2022.02.27. 13:00 | 12 |
| 2022.02.27. 13:15 | 12 |
| 2022.02.27. 13:30 | 12 |
| 2022.02.27. 13:45 | 12 |
| 2022.02.27. 14:00 | 12 |
| 2022.02.27. 14:15 | 12 |
| 2022.02.27. 14:30 | 12 |
| 2022.02.27. 14:45 | 12 |
| 2022.02.27. 15:00 | 12 |
| 2022.02.27. 15:15 | 12 |
| 2022.02.27. 15:30 | 12 |
| 2022.02.27. 15:45 | 12 |
| 2022.02.27. 16:00 | 12 |
| 2022.02.27. 16:15 | 12 |
| 2022.02.27. 16:30 | 12 |
| 2022.02.27. 16:45 | 12 |
| 2022.02.27. 17:00 | 12 |
| 2022.02.27. 17:15 | 12 |
| 2022.02.27. 17:30 | 12 |
| 2022.02.27. 17:45 | 12 |
| 2022.02.27. 18:00 | 12 |
| 2022.02.27. 18:15 | 12 |
| 2022.02.27. 18:30 | 12 |
| 2022.02.27. 18:45 | 12 |
| 2022.02.27. 19:00 | 12 |
| 2022.02.27. 19:15 | 12 |
| 2022.02.27. 19:30 | 12 |
| 2022.02.27. 19:45 | 12 |
| 2022.02.27. 20:00 | 12 |
| 2022.02.27. 20:15 | 12 |
| 2022.02.27. 20:30 | 12 |
| 2022.02.27. 20:45 | 12 |
| 2022.02.27. 21:00 | 12 |
| 2022.02.27. 21:15 | 12 |
| 2022.02.27. 21:30 | 12 |
| 2022.02.27. 21:45 | 12 |
| 2022.02.27. 22:00 | 12 |
| 2022.02.27. 22:15 | 12 |
| 2022.02.27. 22:30 | 12 |
| 2022.02.27. 22:45 | 12 |
| 2022.02.27. 23:00 | 12 |
| 2022.02.27. 23:15 | 12 |
| 2022.02.27. 23:30 | 12 |
| 2022.02.27. 23:45 | 12 |
| 2022.02.28. 00:00 | 12 |
| 2022.02.28. 00:15 | 12 |
| 2022.02.28. 00:30 | 12 |
| 2022.02.28. 00:45 | 12 |
| 2022.02.28. 01:00 | 12 |
| 2022.02.28. 01:15 | 12 |
| 2022.02.28. 01:30 | 12 |
| 2022.02.28. 01:45 | 12 |
| 2022.02.28. 02:00 | 12 |
| 2022.02.28. 02:15 | 12 |
| 2022.02.28. 02:30 | 12 |
| 2022.02.28. 02:45 | 12 |
| 2022.02.28. 03:00 | 12 |
| 2022.02.28. 03:15 | 12 |
| 2022.02.28. 03:30 | 12 |
| 2022.02.28. 03:45 | 12 |
| 2022.02.28. 04:00 | 12 |
| 2022.02.28. 04:15 | 12 |
| 2022.02.28. 04:30 | 12 |
| 2022.02.28. 04:45 | 12 |
| 2022.02.28. 05:00 | 12 |
| 2022.02.28. 05:15 | 12 |
| 2022.02.28. 05:30 | 12 |
| 2022.02.28. 05:45 | 12 |
| 2022.02.28. 06:00 | 12 |
| 2022.02.28. 06:15 | 12 |
| 2022.02.28. 06:30 | 12 |
| 2022.02.28. 06:45 | 12 |
| 2022.02.28. 07:00 | 12 |
| 2022.02.28. 07:15 | 12 |
| 2022.02.28. 07:30 | 12 |
| 2022.02.28. 07:45 | 12 |
| 2022.02.28. 08:00 | 12 |
| 2022.02.28. 08:15 | 12 |
| 2022.02.28. 08:30 | 12 |
| 2022.02.28. 08:45 | 12 |
| 2022.02.28. 09:00 | 12 |
| 2022.02.28. 09:15 | 12 |
| 2022.02.28. 09:30 | 12 |
| 2022.02.28. 09:45 | 12 |
| 2022.02.28. 10:00 | 12 |
| 2022.02.28. 10:15 | 12 |
| 2022.02.28. 10:30 | 12 |
| 2022.02.28. 10:45 | 12 |
| 2022.02.28. 11:00 | 12 |
| 2022.02.28. 11:15 | 12 |
| 2022.02.28. 11:30 | 12 |
| 2022.02.28. 11:45 | 12 |
| 2022.02.28. 12:00 | 12 |
| 2022.02.28. 12:15 | 12 |
| 2022.02.28. 12:30 | 12 |
| 2022.02.28. 12:45 | 12 |
| 2022.02.28. 13:00 | 12 |
| 2022.02.28. 13:15 | 12 |
| 2022.02.28. 13:30 | 12 |
| 2022.02.28. 13:45 | 12 |
| 2022.02.28. 14:00 | 12 |
| 2022.02.28. 14:15 | 12 |
| 2022.02.28. 14:30 | 12 |
| 2022.02.28. 14:45 | 12 |
| 2022.02.28. 15:00 | 12 |
| 2022.02.28. 15:15 | 12 |
| 2022.02.28. 15:30 | 12 |
| 2022.02.28. 15:45 | 12 |
| 2022.02.28. 16:00 | 12 |
| 2022.02.28. 16:15 | 12 |
| 2022.02.28. 16:30 | 12 |
| 2022.02.28. 16:45 | 12 |
| 2022.02.28. 17:00 | 12 |
| 2022.02.28. 17:15 | 12 |
| 2022.02.28. 17:30 | 12 |
| 2022.02.28. 17:45 | 12 |
| 2022.02.28. 18:00 | 12 |
| 2022.02.28. 18:15 | 12 |
| 2022.02.28. 18:30 | 12 |
| 2022.02.28. 18:45 | 12 |
| 2022.02.28. 19:00 | 12 |
| 2022.02.28. 19:15 | 12 |
| 2022.02.28. 19:30 | 12 |
| 2022.02.28. 19:45 | 12 |
| 2022.02.28. 20:00 | 12 |
| 2022.02.28. 20:15 | 12 |
| 2022.02.28. 20:30 | 12 |
| 2022.02.28. 20:45 | 12 |
| 2022.02.28. 21:00 | 12 |
| 2022.02.28. 21:15 | 12 |
| 2022.02.28. 21:30 | 12 |
| 2022.02.28. 21:45 | 12 |
| 2022.02.28. 22:00 | 12 |
| 2022.02.28. 22:15 | 12 |
| 2022.02.28. 22:30 | 12 |
| 2022.02.28. 22:45 | 12 |
| 2022.02.28. 23:00 | 12 |
| 2022.02.28. 23:15 | 12 |
| 2022.02.28. 23:30 | 12 |
| 2022.02.28. 23:45 | 12 |
| 2022.03.01. 00:00 | 12 |
| 2022.03.01. 00:15 | 12 |
| 2022.03.01. 00:30 | 12 |
| 2022.03.01. 00:45 | 12 |
| 2022.03.01. 01:00 | 12 |
| 2022.03.01. 01:15 | 12 |
| 2022.03.01. 01:30 | 12 |
| 2022.03.01. 01:45 | 12 |
| 2022.03.01. 02:00 | 12 |
| 2022.03.01. 02:15 | 12 |
| 2022.03.01. 02:30 | 12 |
| 2022.03.01. 02:45 | 12 |
| 2022.03.01. 03:00 | 12 |
| 2022.03.01. 03:15 | 12 |
| 2022.03.01. 03:30 | 12 |
| 2022.03.01. 03:45 | 12 |
| 2022.03.01. 04:00 | 12 |
| 2022.03.01. 04:15 | 12 |
| 2022.03.01. 04:30 | 12 |
| 2022.03.01. 04:45 | 12 |
| 2022.03.01. 05:00 | 12 |
| 2022.03.01. 05:15 | 12 |
| 2022.03.01. 05:30 | 12 |
| 2022.03.01. 05:45 | 12 |
| 2022.03.01. 06:00 | 12 |
| 2022.03.01. 06:15 | 12 |
| 2022.03.01. 06:30 | 12 |
| 2022.03.01. 06:45 | 12 |
| 2022.03.01. 07:00 | 12 |
| 2022.03.01. 07:15 | 12 |
| 2022.03.01. 07:30 | 12 |
| 2022.03.01. 07:45 | 12 |
| 2022.03.01. 08:00 | 12 |
| 2022.03.01. 08:15 | 12 |
| 2022.03.01. 08:30 | 12 |
| 2022.03.01. 08:45 | 12 |
| 2022.03.01. 09:00 | 12 |
| 2022.03.01. 09:15 | 12 |
| 2022.03.01. 09:30 | 12 |
| 2022.03.01. 09:45 | 12 |
| 2022.03.01. 10:00 | 12 |
| 2022.03.01. 10:15 | 12 |
| 2022.03.01. 10:30 | 12 |
| 2022.03.01. 10:45 | 12 |
| 2022.03.01. 11:00 | 12 |
| 2022.03.01. 11:15 | 12 |
| 2022.03.01. 11:30 | 12 |
| 2022.03.01. 11:45 | 12 |
| 2022.03.01. 12:00 | 12 |
| 2022.03.01. 12:15 | 12 |
| 2022.03.01. 12:30 | 12 |
| 2022.03.01. 12:45 | 12 |
| 2022.03.01. 13:00 | 12 |
| 2022.03.01. 13:15 | 12 |
| 2022.03.01. 13:30 | 12 |
| 2022.03.01. 13:45 | 12 |
| 2022.03.01. 14:00 | 12 |
| 2022.03.01. 14:15 | 12 |
| 2022.03.01. 14:30 | 12 |
| 2022.03.01. 14:45 | 12 |
| 2022.03.01. 15:00 | 12 |
| 2022.03.01. 15:15 | 12 |
| 2022.03.01. 15:30 | 12 |
| 2022.03.01. 15:45 | 12 |
| 2022.03.01. 16:00 | 12 |
| 2022.03.01. 16:15 | 12 |
| 2022.03.01. 16:30 | 12 |
| 2022.03.01. 16:45 | 12 |
| 2022.03.01. 17:00 | 12 |
| 2022.03.01. 17:15 | 12 |
| 2022.03.01. 17:30 | 12 |
| 2022.03.01. 17:45 | 12 |
| 2022.03.01. 18:00 | 12 |
| 2022.03.01. 18:15 | 12 |
| 2022.03.01. 18:30 | 12 |
| 2022.03.01. 18:45 | 12 |
| 2022.03.01. 19:00 | 12 |
| 2022.03.01. 19:15 | 12 |
| 2022.03.01. 19:30 | 12 |
| 2022.03.01. 19:45 | 12 |
| 2022.03.01. 20:00 | 12 |
| 2022.03.01. 20:15 | 12 |
| 2022.03.01. 20:30 | 12 |
| 2022.03.01. 20:45 | 12 |
| 2022.03.01. 21:00 | 12 |
| 2022.03.01. 21:15 | 12 |
| 2022.03.01. 21:30 | 12 |
| 2022.03.01. 21:45 | 12 |
| 2022.03.01. 22:00 | 12 |
| 2022.03.01. 22:15 | 12 |
| 2022.03.01. 22:30 | 12 |
| 2022.03.01. 22:45 | 12 |
| 2022.03.01. 23:00 | 12 |
| 2022.03.01. 23:15 | 12 |
| 2022.03.01. 23:30 | 12 |
| 2022.03.01. 23:45 | 12 |
| 2022.03.02. 00:00 | 12 |
| 2022.03.02. 00:15 | 12 |
| 2022.03.02. 00:30 | 12 |
| 2022.03.02. 00:45 | 12 |
| 2022.03.02. 01:00 | 12 |
| 2022.03.02. 01:15 | 12 |
| 2022.03.02. 01:30 | 12 |
| 2022.03.02. 01:45 | 12 |
| 2022.03.02. 02:00 | 12 |
| 2022.03.02. 02:15 | 12 |
| 2022.03.02. 02:30 | 12 |
| 2022.03.02. 02:45 | 12 |
| 2022.03.02. 03:00 | 12 |
| 2022.03.02. 03:15 | 12 |
| 2022.03.02. 03:30 | 12 |
| 2022.03.02. 03:45 | 12 |
| 2022.03.02. 04:00 | 12 |
| 2022.03.02. 04:15 | 12 |
| 2022.03.02. 04:30 | 12 |
| 2022.03.02. 04:45 | 12 |
| 2022.03.02. 05:00 | 12 |
| 2022.03.02. 05:15 | 12 |
| 2022.03.02. 05:30 | 12 |
| 2022.03.02. 05:45 | 12 |
| 2022.03.02. 06:00 | 12 |
| 2022.03.02. 06:15 | 12 |
| 2022.03.02. 06:30 | 12 |
| 2022.03.02. 06:45 | 12 |
| 2022.03.02. 07:00 | 12 |
| 2022.03.02. 07:15 | 12 |
| 2022.03.02. 07:30 | 12 |
| 2022.03.02. 07:45 | 12 |
| 2022.03.02. 08:00 | 12 |
| 2022.03.02. 08:15 | 12 |
| 2022.03.02. 08:30 | 12 |
| 2022.03.02. 08:45 | 12 |
| 2022.03.02. 09:00 | 12 |
| 2022.03.02. 09:15 | 12 |
| 2022.03.02. 09:30 | 12 |
| 2022.03.02. 09:45 | 12 |
| 2022.03.02. 10:00 | 12 |
| 2022.03.02. 10:15 | 12 |
| 2022.03.02. 10:30 | 12 |
| 2022.03.02. 10:45 | 12 |
| 2022.03.02. 11:00 | 12 |
| 2022.03.02. 11:15 | 12 |
| 2022.03.02. 11:30 | 12 |
| 2022.03.02. 11:45 | 12 |
| 2022.03.02. 12:00 | 12 |
| 2022.03.02. 12:15 | 12 |
| 2022.03.02. 12:30 | 12 |
| 2022.03.02. 12:45 | 12 |
| 2022.03.02. 13:00 | 12 |
| 2022.03.02. 13:15 | 12 |
| 2022.03.02. 13:30 | 12 |
| 2022.03.02. 13:45 | 12 |
| 2022.03.02. 14:00 | 12 |
| 2022.03.02. 14:15 | 12 |
| 2022.03.02. 14:30 | 12 |
| 2022.03.02. 14:45 | 12 |
| 2022.03.02. 15:00 | 12 |
| 2022.03.02. 15:15 | 12 |
| 2022.03.02. 15:30 | 12 |
| 2022.03.02. 15:45 | 12 |
| 2022.03.02. 16:00 | 12 |
| 2022.03.02. 16:15 | 12 |
| 2022.03.02. 16:30 | 12 |
| 2022.03.02. 16:45 | 12 |
| 2022.03.02. 17:00 | 12 |
| 2022.03.02. 17:15 | 12 |
| 2022.03.02. 17:30 | 12 |
| 2022.03.02. 17:45 | 12 |
| 2022.03.02. 18:00 | 12 |
| 2022.03.02. 18:15 | 12 |
| 2022.03.02. 18:30 | 12 |
| 2022.03.02. 18:45 | 12 |
| 2022.03.02. 19:00 | 12 |
| 2022.03.02. 19:15 | 12 |
| 2022.03.02. 19:30 | 12 |
| 2022.03.02. 19:45 | 12 |
| 2022.03.02. 20:00 | 12 |
| 2022.03.02. 20:15 | 12 |
| 2022.03.02. 20:30 | 12 |
| 2022.03.02. 20:45 | 12 |
| 2022.03.02. 21:00 | 12 |
| 2022.03.02. 21:15 | 12 |
| 2022.03.02. 21:30 | 12 |
| 2022.03.02. 21:45 | 12 |
| 2022.03.02. 22:00 | 12 |
| 2022.03.02. 22:15 | 12 |
| 2022.03.02. 22:30 | 12 |
| 2022.03.02. 22:45 | 12 |
| 2022.03.02. 23:00 | 12 |
| 2022.03.02. 23:15 | 12 |
| 2022.03.02. 23:30 | 12 |
| 2022.03.02. 23:45 | 12 |
| 2022.03.03. 00:00 | 12 |
| 2022.03.03. 00:15 | 12 |
| 2022.03.03. 00:30 | 12 |
| 2022.03.03. 00:45 | 12 |
| 2022.03.03. 01:00 | 12 |
| 2022.03.03. 01:15 | 12 |
| 2022.03.03. 01:30 | 12 |
| 2022.03.03. 01:45 | 12 |
| 2022.03.03. 02:00 | 12 |
| 2022.03.03. 02:15 | 12 |
| 2022.03.03. 02:30 | 12 |
| 2022.03.03. 02:45 | 12 |
| 2022.03.03. 03:00 | 12 |
| 2022.03.03. 03:15 | 12 |
| 2022.03.03. 03:30 | 12 |
| 2022.03.03. 03:45 | 12 |
| 2022.03.03. 04:00 | 12 |
| 2022.03.03. 04:15 | 12 |
| 2022.03.03. 04:30 | 12 |
| 2022.03.03. 04:45 | 12 |
| 2022.03.03. 05:00 | 12 |
| 2022.03.03. 05:15 | 12 |
| 2022.03.03. 05:30 | 12 |
| 2022.03.03. 05:45 | 12 |
| 2022.03.03. 06:00 | 12 |
| 2022.03.03. 06:15 | 12 |
| 2022.03.03. 06:30 | 12 |
| 2022.03.03. 06:45 | 12 |
| 2022.03.03. 07:00 | 12 |
| 2022.03.03. 07:15 | 12 |
| 2022.03.03. 07:30 | 12 |
| 2022.03.03. 07:45 | 12 |
| 2022.03.03. 08:00 | 12 |
| 2022.03.03. 08:15 | 12 |
| 2022.03.03. 08:30 | 12 |
| 2022.03.03. 08:45 | 12 |
| 2022.03.03. 09:00 | 12 |
| 2022.03.03. 09:15 | 12 |
| 2022.03.03. 09:30 | 12 |
| 2022.03.03. 09:45 | 12 |
| 2022.03.03. 10:00 | 12 |
| 2022.03.03. 10:15 | 12 |
| 2022.03.03. 10:30 | 12 |
| 2022.03.03. 10:45 | 12 |
| 2022.03.03. 11:00 | 12 |
| 2022.03.03. 11:15 | 12 |
| 2022.03.03. 11:30 | 12 |
| 2022.03.03. 11:45 | 12 |
| 2022.03.03. 12:00 | 12 |
| 2022.03.03. 12:15 | 12 |
| 2022.03.03. 12:30 | 12 |
| 2022.03.03. 12:45 | 12 |
| 2022.03.03. 13:00 | 12 |
| 2022.03.03. 13:15 | 12 |
| 2022.03.03. 13:30 | 12 |
| 2022.03.03. 13:45 | 12 |
| 2022.03.03. 14:00 | 12 |
| 2022.03.03. 14:15 | 12 |
| 2022.03.03. 14:30 | 12 |
| 2022.03.03. 14:45 | 12 |
| 2022.03.03. 15:00 | 12 |
| 2022.03.03. 15:15 | 12 |
| 2022.03.03. 15:30 | 12 |
| 2022.03.03. 15:45 | 12 |
| 2022.03.03. 16:00 | 12 |
| 2022.03.03. 16:15 | 12 |
| 2022.03.03. 16:30 | 12 |
| 2022.03.03. 16:45 | 12 |
| 2022.03.03. 17:00 | 12 |
| 2022.03.03. 17:15 | 12 |
| 2022.03.03. 17:30 | 12 |
| 2022.03.03. 17:45 | 12 |
| 2022.03.03. 18:00 | 12 |
| 2022.03.03. 18:15 | 12 |
| 2022.03.03. 18:30 | 12 |
| 2022.03.03. 18:45 | 12 |
| 2022.03.03. 19:00 | 12 |
| 2022.03.03. 19:15 | 12 |
| 2022.03.03. 19:30 | 12 |
| 2022.03.03. 19:45 | 12 |
| 2022.03.03. 20:00 | 12 |
| 2022.03.03. 20:15 | 12 |
| 2022.03.03. 20:30 | 12 |
| 2022.03.03. 20:45 | 12 |
| 2022.03.03. 21:00 | 12 |
| 2022.03.03. 21:15 | 12 |
| 2022.03.03. 21:30 | 12 |
| 2022.03.03. 21:45 | 12 |
| 2022.03.03. 22:00 | 12 |
| 2022.03.03. 22:15 | 12 |
| 2022.03.03. 22:30 | 12 |
| 2022.03.03. 22:45 | 12 |
| 2022.03.03. 23:00 | 12 |
| 2022.03.03. 23:15 | 12 |
| 2022.03.03. 23:30 | 12 |
| 2022.03.03. 23:45 | 12 |
| 2022.03.04. 00:00 | 12 |
| 2022.03.04. 00:15 | 12 |
| 2022.03.04. 00:30 | 12 |
| 2022.03.04. 00:45 | 12 |
| 2022.03.04. 01:00 | 12 |
| 2022.03.04. 01:15 | 12 |
| 2022.03.04. 01:30 | 12 |
| 2022.03.04. 01:45 | 12 |
| 2022.03.04. 02:00 | 12 |
| 2022.03.04. 02:15 | 12 |
| 2022.03.04. 02:30 | 12 |
| 2022.03.04. 02:45 | 12 |
| 2022.03.04. 03:00 | 12 |
| 2022.03.04. 03:15 | 12 |
| 2022.03.04. 03:30 | 12 |
| 2022.03.04. 03:45 | 12 |
| 2022.03.04. 04:00 | 12 |
| 2022.03.04. 04:15 | 12 |
| 2022.03.04. 04:30 | 12 |
| 2022.03.04. 04:45 | 12 |
| 2022.03.04. 05:00 | 12 |
| 2022.03.04. 05:15 | 12 |
| 2022.03.04. 05:30 | 12 |
| 2022.03.04. 05:45 | 12 |
| 2022.03.04. 06:00 | 12 |
| 2022.03.04. 06:15 | 12 |
| 2022.03.04. 06:30 | 12 |
| 2022.03.04. 06:45 | 12 |
| 2022.03.04. 07:00 | 12 |
| 2022.03.04. 07:15 | 12 |
| 2022.03.04. 07:30 | 12 |
| 2022.03.04. 07:45 | 12 |
| 2022.03.04. 08:00 | 12 |
| 2022.03.04. 08:15 | 12 |
| 2022.03.04. 08:30 | 12 |
| 2022.03.04. 08:45 | 12 |
| 2022.03.04. 09:00 | 12 |
| 2022.03.04. 09:15 | 12 |
| 2022.03.04. 09:30 | 12 |
| 2022.03.04. 09:45 | 12 |
| 2022.03.04. 10:00 | 12 |
| 2022.03.04. 10:15 | 12 |
| 2022.03.04. 10:30 | 12 |
| 2022.03.04. 10:45 | 12 |
| 2022.03.04. 11:00 | 12 |
| 2022.03.04. 11:15 | 12 |
| 2022.03.04. 11:30 | 12 |
| 2022.03.04. 11:45 | 12 |
| 2022.03.04. 12:00 | 12 |
| 2022.03.04. 12:15 | 12 |
| 2022.03.04. 12:30 | 12 |
| 2022.03.04. 12:45 | 12 |
| 2022.03.04. 13:00 | 12 |
| 2022.03.04. 13:15 | 12 |
| 2022.03.04. 13:30 | 12 |
| 2022.03.04. 13:45 | 12 |
| 2022.03.04. 14:00 | 12 |
| 2022.03.04. 14:15 | 12 |
| 2022.03.04. 14:30 | 12 |
| 2022.03.04. 14:45 | 12 |
| 2022.03.04. 15:00 | 12 |
| 2022.03.04. 15:15 | 12 |
| 2022.03.04. 15:30 | 12 |
| 2022.03.04. 15:45 | 12 |
| 2022.03.04. 16:00 | 12 |
| 2022.03.04. 16:15 | 12 |
| 2022.03.04. 16:30 | 12 |
| 2022.03.04. 16:45 | 12 |
| 2022.03.04. 17:00 | 12 |
| 2022.03.04. 17:15 | 12 |
| 2022.03.04. 17:30 | 12 |
| 2022.03.04. 17:45 | 12 |
| 2022.03.04. 18:00 | 12 |
| 2022.03.04. 18:15 | 12 |
| 2022.03.04. 18:30 | 12 |
| 2022.03.04. 18:45 | 12 |
| 2022.03.04. 19:00 | 12 |
| 2022.03.04. 19:15 | 12 |
| 2022.03.04. 19:30 | 12 |
| 2022.03.04. 19:45 | 12 |
| 2022.03.04. 20:00 | 12 |
| 2022.03.04. 20:15 | 12 |
| 2022.03.04. 20:30 | 12 |
| 2022.03.04. 20:45 | 12 |
| 2022.03.04. 21:00 | 12 |
| 2022.03.04. 21:15 | 12 |
| 2022.03.04. 21:30 | 12 |
| 2022.03.04. 21:45 | 12 |
| 2022.03.04. 22:00 | 12 |
| 2022.03.04. 22:15 | 12 |
| 2022.03.04. 22:30 | 12 |
| 2022.03.04. 22:45 | 12 |
| 2022.03.04. 23:00 | 12 |
| 2022.03.04. 23:15 | 12 |
| 2022.03.04. 23:30 | 12 |
| 2022.03.04. 23:45 | 12 |
| 2022.03.05. 00:00 | 12 |
| 2022.03.05. 00:15 | 12 |
| 2022.03.05. 00:30 | 12 |
| 2022.03.05. 00:45 | 12 |
| 2022.03.05. 01:00 | 12 |
| 2022.03.05. 01:15 | 12 |
| 2022.03.05. 01:30 | 12 |
| 2022.03.05. 01:45 | 12 |
| 2022.03.05. 02:00 | 12 |
| 2022.03.05. 02:15 | 12 |
| 2022.03.05. 02:30 | 12 |
| 2022.03.05. 02:45 | 12 |
| 2022.03.05. 03:00 | 12 |
| 2022.03.05. 03:15 | 12 |
| 2022.03.05. 03:30 | 12 |
| 2022.03.05. 03:45 | 12 |
| 2022.03.05. 04:00 | 12 |
| 2022.03.05. 04:15 | 12 |
| 2022.03.05. 04:30 | 12 |
| 2022.03.05. 04:45 | 12 |
| 2022.03.05. 05:00 | 12 |
| 2022.03.05. 05:15 | 12 |
| 2022.03.05. 05:30 | 12 |
| 2022.03.05. 05:45 | 12 |
| 2022.03.05. 06:00 | 12 |
| 2022.03.05. 06:15 | 12 |
| 2022.03.05. 06:30 | 12 |
| 2022.03.05. 06:45 | 12 |
| 2022.03.05. 07:00 | 12 |
| 2022.03.05. 07:15 | 12 |
| 2022.03.05. 07:30 | 12 |
| 2022.03.05. 07:45 | 12 |
| 2022.03.05. 08:00 | 12 |
| 2022.03.05. 08:15 | 12 |
| 2022.03.05. 08:30 | 12 |
| 2022.03.05. 08:45 | 12 |
| 2022.03.05. 09:00 | 12 |
| 2022.03.05. 09:15 | 12 |
| 2022.03.05. 09:30 | 12 |
| 2022.03.05. 09:45 | 12 |
| 2022.03.05. 10:00 | 12 |
| 2022.03.05. 10:15 | 12 |
| 2022.03.05. 10:30 | 12 |
| 2022.03.05. 10:45 | 12 |
| 2022.03.05. 11:00 | 12 |
| 2022.03.05. 11:15 | 12 |
| 2022.03.05. 11:30 | 12 |
| 2022.03.05. 11:45 | 12 |
| 2022.03.05. 12:00 | 12 |
| 2022.03.05. 12:15 | 12 |
| 2022.03.05. 12:30 | 12 |
| 2022.03.05. 12:45 | 12 |
| 2022.03.05. 13:00 | 12 |
| 2022.03.05. 13:15 | 12 |
| 2022.03.05. 13:30 | 12 |
| 2022.03.05. 13:45 | 12 |
| 2022.03.05. 14:00 | 12 |
| 2022.03.05. 14:15 | 12 |
| 2022.03.05. 14:30 | 12 |
| 2022.03.05. 14:45 | 12 |
| 2022.03.05. 15:00 | 12 |
| 2022.03.05. 15:15 | 12 |
| 2022.03.05. 15:30 | 12 |
| 2022.03.05. 15:45 | 12 |
| 2022.03.05. 16:00 | 12 |
| 2022.03.05. 16:15 | 12 |
| 2022.03.05. 16:30 | 12 |
| 2022.03.05. 16:45 | 12 |
| 2022.03.05. 17:00 | 12 |
| 2022.03.05. 17:15 | 12 |
| 2022.03.05. 17:30 | 12 |
| 2022.03.05. 17:45 | 12 |
| 2022.03.05. 18:00 | 12 |
| 2022.03.05. 18:15 | 12 |
| 2022.03.05. 18:30 | 12 |
| 2022.03.05. 18:45 | 12 |
| 2022.03.05. 19:00 | 12 |
| 2022.03.05. 19:15 | 12 |
| 2022.03.05. 19:30 | 12 |
| 2022.03.05. 19:45 | 12 |
| 2022.03.05. 20:00 | 12 |
| 2022.03.05. 20:15 | 12 |
| 2022.03.05. 20:30 | 12 |
| 2022.03.05. 20:45 | 12 |
| 2022.03.05. 21:00 | 12 |
| 2022.03.05. 21:15 | 12 |
| 2022.03.05. 21:30 | 12 |
| 2022.03.05. 21:45 | 12 |
| 2022.03.05. 22:00 | 12 |
| 2022.03.05. 22:15 | 12 |
| 2022.03.05. 22:30 | 12 |
| 2022.03.05. 22:45 | 12 |
| 2022.03.05. 23:00 | 12 |
| 2022.03.05. 23:15 | 12 |
| 2022.03.05. 23:30 | 12 |
| 2022.03.05. 23:45 | 12 |
| 2022.03.06. 00:00 | 16 |
| 2022.03.06. 00:15 | 16 |
| 2022.03.06. 00:30 | 16 |
| 2022.03.06. 00:45 | 16 |
| 2022.03.06. 01:00 | 16 |
| 2022.03.06. 01:15 | 16 |
| 2022.03.06. 01:30 | 16 |
| 2022.03.06. 01:45 | 16 |
| 2022.03.06. 02:00 | 16 |
| 2022.03.06. 02:15 | 16 |
| 2022.03.06. 02:30 | 16 |
| 2022.03.06. 02:45 | 16 |
| 2022.03.06. 03:00 | 16 |
| 2022.03.06. 03:15 | 16 |
| 2022.03.06. 03:30 | 16 |
| 2022.03.06. 03:45 | 16 |
| 2022.03.06. 04:00 | 16 |
| 2022.03.06. 04:15 | 16 |
| 2022.03.06. 04:30 | 16 |
| 2022.03.06. 04:45 | 16 |
| 2022.03.06. 05:00 | 16 |
| 2022.03.06. 05:15 | 16 |
| 2022.03.06. 05:30 | 16 |
| 2022.03.06. 05:45 | 16 |
| 2022.03.06. 06:00 | 16 |
| 2022.03.06. 06:15 | 16 |
| 2022.03.06. 06:30 | 16 |
| 2022.03.06. 06:45 | 16 |
| 2022.03.06. 07:00 | 16 |
| 2022.03.06. 07:15 | 16 |
| 2022.03.06. 07:30 | 16 |
| 2022.03.06. 07:45 | 16 |
| 2022.03.06. 08:00 | 16 |
| 2022.03.06. 08:15 | 16 |
| 2022.03.06. 08:30 | 16 |
| 2022.03.06. 08:45 | 16 |
| 2022.03.06. 09:00 | 16 |
| 2022.03.06. 09:15 | 16 |
| 2022.03.06. 09:30 | 16 |
| 2022.03.06. 09:45 | 16 |
| 2022.03.06. 10:00 | 16 |
| 2022.03.06. 10:15 | 16 |
| 2022.03.06. 10:30 | 16 |
| 2022.03.06. 10:45 | 16 |
| 2022.03.06. 11:00 | 16 |
| 2022.03.06. 11:15 | 16 |
| 2022.03.06. 11:30 | 16 |
| 2022.03.06. 11:45 | 16 |
| 2022.03.06. 12:00 | 16 |
| 2022.03.06. 12:15 | 16 |
| 2022.03.06. 12:30 | 16 |
| 2022.03.06. 12:45 | 16 |
| 2022.03.06. 13:00 | 16 |
| 2022.03.06. 13:15 | 16 |
| 2022.03.06. 13:30 | 16 |
| 2022.03.06. 13:45 | 16 |
| 2022.03.06. 14:00 | 16 |
| 2022.03.06. 14:15 | 16 |
| 2022.03.06. 14:30 | 16 |
| 2022.03.06. 14:45 | 16 |
| 2022.03.06. 15:00 | 16 |
| 2022.03.06. 15:15 | 16 |
| 2022.03.06. 15:30 | 16 |
| 2022.03.06. 15:45 | 16 |
| 2022.03.06. 16:00 | 16 |
| 2022.03.06. 16:15 | 16 |
| 2022.03.06. 16:30 | 16 |
| 2022.03.06. 16:45 | 16 |
| 2022.03.06. 17:00 | 16 |
| 2022.03.06. 17:15 | 16 |
| 2022.03.06. 17:30 | 16 |
| 2022.03.06. 17:45 | 16 |
| 2022.03.06. 18:00 | 16 |
| 2022.03.06. 18:15 | 16 |
| 2022.03.06. 18:30 | 16 |
| 2022.03.06. 18:45 | 16 |
| 2022.03.06. 19:00 | 16 |
| 2022.03.06. 19:15 | 16 |
| 2022.03.06. 19:30 | 16 |
| 2022.03.06. 19:45 | 16 |
| 2022.03.06. 20:00 | 16 |
| 2022.03.06. 20:15 | 16 |
| 2022.03.06. 20:30 | 16 |
| 2022.03.06. 20:45 | 16 |
| 2022.03.06. 21:00 | 16 |
| 2022.03.06. 21:15 | 16 |
| 2022.03.06. 21:30 | 16 |
| 2022.03.06. 21:45 | 16 |
| 2022.03.06. 22:00 | 16 |
| 2022.03.06. 22:15 | 16 |
| 2022.03.06. 22:30 | 16 |
| 2022.03.06. 22:45 | 16 |
| 2022.03.06. 23:00 | 16 |
| 2022.03.06. 23:15 | 16 |
| 2022.03.06. 23:30 | 16 |
| 2022.03.06. 23:45 | 16 |
| 2022.03.07. 00:00 | 16 |
| 2022.03.07. 00:15 | 16 |
| 2022.03.07. 00:30 | 16 |
| 2022.03.07. 00:45 | 16 |
| 2022.03.07. 01:00 | 16 |
| 2022.03.07. 01:15 | 16 |
| 2022.03.07. 01:30 | 16 |
| 2022.03.07. 01:45 | 16 |
| 2022.03.07. 02:00 | 16 |
| 2022.03.07. 02:15 | 16 |
| 2022.03.07. 02:30 | 16 |
| 2022.03.07. 02:45 | 16 |
| 2022.03.07. 03:00 | 16 |
| 2022.03.07. 03:15 | 16 |
| 2022.03.07. 03:30 | 16 |
| 2022.03.07. 03:45 | 16 |
| 2022.03.07. 04:00 | 16 |
| 2022.03.07. 04:15 | 16 |
| 2022.03.07. 04:30 | 16 |
| 2022.03.07. 04:45 | 16 |
| 2022.03.07. 05:00 | 16 |
| 2022.03.07. 05:15 | 16 |
| 2022.03.07. 05:30 | 16 |
| 2022.03.07. 05:45 | 16 |
| 2022.03.07. 06:00 | 16 |
| 2022.03.07. 06:15 | 16 |
| 2022.03.07. 06:30 | 16 |
| 2022.03.07. 06:45 | 16 |
| 2022.03.07. 07:00 | 16 |
| 2022.03.07. 07:15 | 16 |
| 2022.03.07. 07:30 | 16 |
| 2022.03.07. 07:45 | 16 |
| 2022.03.07. 08:00 | 16 |
| 2022.03.07. 08:15 | 16 |
| 2022.03.07. 08:30 | 16 |
| 2022.03.07. 08:45 | 16 |
| 2022.03.07. 09:00 | 16 |
| 2022.03.07. 09:15 | 16 |
| 2022.03.07. 09:30 | 16 |
| 2022.03.07. 09:45 | 16 |
| 2022.03.07. 10:00 | 16 |
| 2022.03.07. 10:15 | 16 |
| 2022.03.07. 10:30 | 16 |
| 2022.03.07. 10:45 | 16 |
| 2022.03.07. 11:00 | 16 |
| 2022.03.07. 11:15 | 16 |
| 2022.03.07. 11:30 | 16 |
| 2022.03.07. 11:45 | 16 |
| 2022.03.07. 12:00 | 16 |
| 2022.03.07. 12:15 | 16 |
| 2022.03.07. 12:30 | 16 |
| 2022.03.07. 12:45 | 16 |
| 2022.03.07. 13:00 | 16 |
| 2022.03.07. 13:15 | 16 |
| 2022.03.07. 13:30 | 16 |
| 2022.03.07. 13:45 | 16 |
| 2022.03.07. 14:00 | 16 |
| 2022.03.07. 14:15 | 16 |
| 2022.03.07. 14:30 | 16 |
| 2022.03.07. 14:45 | 16 |
| 2022.03.07. 15:00 | 16 |
| 2022.03.07. 15:15 | 16 |
| 2022.03.07. 15:30 | 16 |
| 2022.03.07. 15:45 | 16 |
| 2022.03.07. 16:00 | 16 |
| 2022.03.07. 16:15 | 16 |
| 2022.03.07. 16:30 | 16 |
| 2022.03.07. 16:45 | 16 |
| 2022.03.07. 17:00 | 16 |
| 2022.03.07. 17:15 | 16 |
| 2022.03.07. 17:30 | 16 |
| 2022.03.07. 17:45 | 16 |
| 2022.03.07. 18:00 | 16 |
| 2022.03.07. 18:15 | 16 |
| 2022.03.07. 18:30 | 16 |
| 2022.03.07. 18:45 | 16 |
| 2022.03.07. 19:00 | 16 |
| 2022.03.07. 19:15 | 16 |
| 2022.03.07. 19:30 | 16 |
| 2022.03.07. 19:45 | 16 |
| 2022.03.07. 20:00 | 16 |
| 2022.03.07. 20:15 | 16 |
| 2022.03.07. 20:30 | 16 |
| 2022.03.07. 20:45 | 16 |
| 2022.03.07. 21:00 | 16 |
| 2022.03.07. 21:15 | 16 |
| 2022.03.07. 21:30 | 16 |
| 2022.03.07. 21:45 | 16 |
| 2022.03.07. 22:00 | 16 |
| 2022.03.07. 22:15 | 16 |
| 2022.03.07. 22:30 | 16 |
| 2022.03.07. 22:45 | 16 |
| 2022.03.07. 23:00 | 16 |
| 2022.03.07. 23:15 | 16 |
| 2022.03.07. 23:30 | 16 |
| 2022.03.07. 23:45 | 16 |
| 2022.03.08. 00:00 | 16 |
| 2022.03.08. 00:15 | 16 |
| 2022.03.08. 00:30 | 16 |
| 2022.03.08. 00:45 | 16 |
| 2022.03.08. 01:00 | 16 |
| 2022.03.08. 01:15 | 16 |
| 2022.03.08. 01:30 | 16 |
| 2022.03.08. 01:45 | 16 |
| 2022.03.08. 02:00 | 16 |
| 2022.03.08. 02:15 | 16 |
| 2022.03.08. 02:30 | 16 |
| 2022.03.08. 02:45 | 16 |
| 2022.03.08. 03:00 | 16 |
| 2022.03.08. 03:15 | 16 |
| 2022.03.08. 03:30 | 16 |
| 2022.03.08. 03:45 | 16 |
| 2022.03.08. 04:00 | 16 |
| 2022.03.08. 04:15 | 16 |
| 2022.03.08. 04:30 | 16 |
| 2022.03.08. 04:45 | 16 |
| 2022.03.08. 05:00 | 16 |
| 2022.03.08. 05:15 | 16 |
| 2022.03.08. 05:30 | 16 |
| 2022.03.08. 05:45 | 16 |
| 2022.03.08. 06:00 | 16 |
| 2022.03.08. 06:15 | 16 |
| 2022.03.08. 06:30 | 16 |
| 2022.03.08. 06:45 | 16 |
| 2022.03.08. 07:00 | 16 |
| 2022.03.08. 07:15 | 16 |
| 2022.03.08. 07:30 | 16 |
| 2022.03.08. 07:45 | 16 |
| 2022.03.08. 08:00 | 16 |
| 2022.03.08. 08:15 | 16 |
| 2022.03.08. 08:30 | 16 |
| 2022.03.08. 08:45 | 16 |
| 2022.03.08. 09:00 | 16 |
| 2022.03.08. 09:15 | 16 |
| 2022.03.08. 09:30 | 16 |
| 2022.03.08. 09:45 | 16 |
| 2022.03.08. 10:00 | 16 |
| 2022.03.08. 10:15 | 16 |
| 2022.03.08. 10:30 | 16 |
| 2022.03.08. 10:45 | 16 |
| 2022.03.08. 11:00 | 16 |
| 2022.03.08. 11:15 | 16 |
| 2022.03.08. 11:30 | 16 |
| 2022.03.08. 11:45 | 16 |
| 2022.03.08. 12:00 | 16 |
| 2022.03.08. 12:15 | 16 |
| 2022.03.08. 12:30 | 16 |
| 2022.03.08. 12:45 | 16 |
| 2022.03.08. 13:00 | 16 |
| 2022.03.08. 13:15 | 16 |
| 2022.03.08. 13:30 | 16 |
| 2022.03.08. 13:45 | 16 |
| 2022.03.08. 14:00 | 16 |
| 2022.03.08. 14:15 | 16 |
| 2022.03.08. 14:30 | 16 |
| 2022.03.08. 14:45 | 16 |
| 2022.03.08. 15:00 | 16 |
| 2022.03.08. 15:15 | 16 |
| 2022.03.08. 15:30 | 16 |
| 2022.03.08. 15:45 | 16 |
| 2022.03.08. 16:00 | 16 |
| 2022.03.08. 16:15 | 16 |
| 2022.03.08. 16:30 | 16 |
| 2022.03.08. 16:45 | 16 |
| 2022.03.08. 17:00 | 16 |
| 2022.03.08. 17:15 | 16 |
| 2022.03.08. 17:30 | 16 |
| 2022.03.08. 17:45 | 16 |
| 2022.03.08. 18:00 | 16 |
| 2022.03.08. 18:15 | 16 |
| 2022.03.08. 18:30 | 16 |
| 2022.03.08. 18:45 | 16 |
| 2022.03.08. 19:00 | 16 |
| 2022.03.08. 19:15 | 16 |
| 2022.03.08. 19:30 | 16 |
| 2022.03.08. 19:45 | 16 |
| 2022.03.08. 20:00 | 16 |
| 2022.03.08. 20:15 | 16 |
| 2022.03.08. 20:30 | 16 |
| 2022.03.08. 20:45 | 16 |
| 2022.03.08. 21:00 | 16 |
| 2022.03.08. 21:15 | 16 |
| 2022.03.08. 21:30 | 16 |
| 2022.03.08. 21:45 | 16 |
| 2022.03.08. 22:00 | 16 |
| 2022.03.08. 22:15 | 16 |
| 2022.03.08. 22:30 | 16 |
| 2022.03.08. 22:45 | 16 |
| 2022.03.08. 23:00 | 16 |
| 2022.03.08. 23:15 | 16 |
| 2022.03.08. 23:30 | 16 |
| 2022.03.08. 23:45 | 16 |
| 2022.03.09. 00:00 | 16 |
| 2022.03.09. 00:15 | 16 |
| 2022.03.09. 00:30 | 16 |
| 2022.03.09. 00:45 | 16 |
| 2022.03.09. 01:00 | 16 |
| 2022.03.09. 01:15 | 16 |
| 2022.03.09. 01:30 | 16 |
| 2022.03.09. 01:45 | 16 |
| 2022.03.09. 02:00 | 16 |
| 2022.03.09. 02:15 | 16 |
| 2022.03.09. 02:30 | 16 |
| 2022.03.09. 02:45 | 16 |
| 2022.03.09. 03:00 | 16 |
| 2022.03.09. 03:15 | 16 |
| 2022.03.09. 03:30 | 16 |
| 2022.03.09. 03:45 | 16 |
| 2022.03.09. 04:00 | 16 |
| 2022.03.09. 04:15 | 16 |
| 2022.03.09. 04:30 | 16 |
| 2022.03.09. 04:45 | 16 |
| 2022.03.09. 05:00 | 16 |
| 2022.03.09. 05:15 | 16 |
| 2022.03.09. 05:30 | 16 |
| 2022.03.09. 05:45 | 16 |
| 2022.03.09. 06:00 | 16 |
| 2022.03.09. 06:15 | 16 |
| 2022.03.09. 06:30 | 16 |
| 2022.03.09. 06:45 | 16 |
| 2022.03.09. 07:00 | 16 |
| 2022.03.09. 07:15 | 16 |
| 2022.03.09. 07:30 | 16 |
| 2022.03.09. 07:45 | 16 |
| 2022.03.09. 08:00 | 16 |
| 2022.03.09. 08:15 | 16 |
| 2022.03.09. 08:30 | 16 |
| 2022.03.09. 08:45 | 16 |
| 2022.03.09. 09:00 | 16 |
| 2022.03.09. 09:15 | 16 |
| 2022.03.09. 09:30 | 16 |
| 2022.03.09. 09:45 | 16 |
| 2022.03.09. 10:00 | 16 |
| 2022.03.09. 10:15 | 16 |
| 2022.03.09. 10:30 | 16 |
| 2022.03.09. 10:45 | 16 |
| 2022.03.09. 11:00 | 16 |
| 2022.03.09. 11:15 | 16 |
| 2022.03.09. 11:30 | 16 |
| 2022.03.09. 11:45 | 16 |
| 2022.03.09. 12:00 | 16 |
| 2022.03.09. 12:15 | 16 |
| 2022.03.09. 12:30 | 16 |
| 2022.03.09. 12:45 | 16 |
| 2022.03.09. 13:00 | 16 |
| 2022.03.09. 13:15 | 16 |
| 2022.03.09. 13:30 | 16 |
| 2022.03.09. 13:45 | 16 |
| 2022.03.09. 14:00 | 16 |
| 2022.03.09. 14:15 | 16 |
| 2022.03.09. 14:30 | 16 |
| 2022.03.09. 14:45 | 16 |
| 2022.03.09. 15:00 | 16 |
| 2022.03.09. 15:15 | 16 |
| 2022.03.09. 15:30 | 16 |
| 2022.03.09. 15:45 | 16 |
| 2022.03.09. 16:00 | 16 |
| 2022.03.09. 16:15 | 16 |
| 2022.03.09. 16:30 | 16 |
| 2022.03.09. 16:45 | 16 |
| 2022.03.09. 17:00 | 16 |
| 2022.03.09. 17:15 | 16 |
| 2022.03.09. 17:30 | 16 |
| 2022.03.09. 17:45 | 16 |
| 2022.03.09. 18:00 | 16 |
| 2022.03.09. 18:15 | 16 |
| 2022.03.09. 18:30 | 16 |
| 2022.03.09. 18:45 | 16 |
| 2022.03.09. 19:00 | 16 |
| 2022.03.09. 19:15 | 16 |
| 2022.03.09. 19:30 | 16 |
| 2022.03.09. 19:45 | 16 |
| 2022.03.09. 20:00 | 16 |
| 2022.03.09. 20:15 | 16 |
| 2022.03.09. 20:30 | 16 |
| 2022.03.09. 20:45 | 16 |
| 2022.03.09. 21:00 | 16 |
| 2022.03.09. 21:15 | 16 |
| 2022.03.09. 21:30 | 16 |
| 2022.03.09. 21:45 | 16 |
| 2022.03.09. 22:00 | 16 |
| 2022.03.09. 22:15 | 16 |
| 2022.03.09. 22:30 | 16 |
| 2022.03.09. 22:45 | 16 |
| 2022.03.09. 23:00 | 16 |
| 2022.03.09. 23:15 | 16 |
| 2022.03.09. 23:30 | 16 |
| 2022.03.09. 23:45 | 16 |
| 2022.03.10. 00:00 | 16 |
| 2022.03.10. 00:15 | 16 |
| 2022.03.10. 00:30 | 16 |
| 2022.03.10. 00:45 | 16 |
| 2022.03.10. 01:00 | 16 |
| 2022.03.10. 01:15 | 16 |
| 2022.03.10. 01:30 | 16 |
| 2022.03.10. 01:45 | 16 |
| 2022.03.10. 02:00 | 16 |
| 2022.03.10. 02:15 | 16 |
| 2022.03.10. 02:30 | 16 |
| 2022.03.10. 02:45 | 16 |
| 2022.03.10. 03:00 | 16 |
| 2022.03.10. 03:15 | 16 |
| 2022.03.10. 03:30 | 16 |
| 2022.03.10. 03:45 | 16 |
| 2022.03.10. 04:00 | 16 |
| 2022.03.10. 04:15 | 16 |
| 2022.03.10. 04:30 | 16 |
| 2022.03.10. 04:45 | 16 |
| 2022.03.10. 05:00 | 16 |
| 2022.03.10. 05:15 | 16 |
| 2022.03.10. 05:30 | 16 |
| 2022.03.10. 05:45 | 16 |
| 2022.03.10. 06:00 | 16 |
| 2022.03.10. 06:15 | 16 |
| 2022.03.10. 06:30 | 16 |
| 2022.03.10. 06:45 | 16 |
| 2022.03.10. 07:00 | 16 |
| 2022.03.10. 07:15 | 16 |
| 2022.03.10. 07:30 | 16 |
| 2022.03.10. 07:45 | 16 |
| 2022.03.10. 08:00 | 16 |
| 2022.03.10. 08:15 | 16 |
| 2022.03.10. 08:30 | 16 |
| 2022.03.10. 08:45 | 16 |
| 2022.03.10. 09:00 | 16 |
| 2022.03.10. 09:15 | 16 |
| 2022.03.10. 09:30 | 16 |
| 2022.03.10. 09:45 | 16 |
| 2022.03.10. 10:00 | 16 |
| 2022.03.10. 10:15 | 16 |
| 2022.03.10. 10:30 | 16 |
| 2022.03.10. 10:45 | 16 |
| 2022.03.10. 11:00 | 16 |
| 2022.03.10. 11:15 | 16 |
| 2022.03.10. 11:30 | 16 |
| 2022.03.10. 11:45 | 16 |
| 2022.03.10. 12:00 | 16 |
| 2022.03.10. 12:15 | 16 |
| 2022.03.10. 12:30 | 16 |
| 2022.03.10. 12:45 | 16 |
| 2022.03.10. 13:00 | 16 |
| 2022.03.10. 13:15 | 16 |
| 2022.03.10. 13:30 | 16 |
| 2022.03.10. 13:45 | 16 |
| 2022.03.10. 14:00 | 16 |
| 2022.03.10. 14:15 | 16 |
| 2022.03.10. 14:30 | 16 |
| 2022.03.10. 14:45 | 16 |
| 2022.03.10. 15:00 | 16 |
| 2022.03.10. 15:15 | 16 |
| 2022.03.10. 15:30 | 16 |
| 2022.03.10. 15:45 | 16 |
| 2022.03.10. 16:00 | 16 |
| 2022.03.10. 16:15 | 16 |
| 2022.03.10. 16:30 | 16 |
| 2022.03.10. 16:45 | 16 |
| 2022.03.10. 17:00 | 16 |
| 2022.03.10. 17:15 | 16 |
| 2022.03.10. 17:30 | 16 |
| 2022.03.10. 17:45 | 16 |
| 2022.03.10. 18:00 | 16 |
| 2022.03.10. 18:15 | 16 |
| 2022.03.10. 18:30 | 16 |
| 2022.03.10. 18:45 | 16 |
| 2022.03.10. 19:00 | 16 |
| 2022.03.10. 19:15 | 16 |
| 2022.03.10. 19:30 | 16 |
| 2022.03.10. 19:45 | 16 |
| 2022.03.10. 20:00 | 16 |
| 2022.03.10. 20:15 | 16 |
| 2022.03.10. 20:30 | 16 |
| 2022.03.10. 20:45 | 16 |
| 2022.03.10. 21:00 | 16 |
| 2022.03.10. 21:15 | 16 |
| 2022.03.10. 21:30 | 16 |
| 2022.03.10. 21:45 | 16 |
| 2022.03.10. 22:00 | 16 |
| 2022.03.10. 22:15 | 16 |
| 2022.03.10. 22:30 | 16 |
| 2022.03.10. 22:45 | 16 |
| 2022.03.10. 23:00 | 16 |
| 2022.03.10. 23:15 | 16 |
| 2022.03.10. 23:30 | 16 |
| 2022.03.10. 23:45 | 16 |
| 2022.03.11. 00:00 | 16 |
| 2022.03.11. 00:15 | 16 |
| 2022.03.11. 00:30 | 16 |
| 2022.03.11. 00:45 | 16 |
| 2022.03.11. 01:00 | 16 |
| 2022.03.11. 01:15 | 16 |
| 2022.03.11. 01:30 | 16 |
| 2022.03.11. 01:45 | 16 |
| 2022.03.11. 02:00 | 16 |
| 2022.03.11. 02:15 | 16 |
| 2022.03.11. 02:30 | 16 |
| 2022.03.11. 02:45 | 16 |
| 2022.03.11. 03:00 | 16 |
| 2022.03.11. 03:15 | 16 |
| 2022.03.11. 03:30 | 16 |
| 2022.03.11. 03:45 | 16 |
| 2022.03.11. 04:00 | 16 |
| 2022.03.11. 04:15 | 16 |
| 2022.03.11. 04:30 | 16 |
| 2022.03.11. 04:45 | 16 |
| 2022.03.11. 05:00 | 16 |
| 2022.03.11. 05:15 | 16 |
| 2022.03.11. 05:30 | 16 |
| 2022.03.11. 05:45 | 16 |
| 2022.03.11. 06:00 | 16 |
| 2022.03.11. 06:15 | 16 |
| 2022.03.11. 06:30 | 16 |
| 2022.03.11. 06:45 | 16 |
| 2022.03.11. 07:00 | 16 |
| 2022.03.11. 07:15 | 16 |
| 2022.03.11. 07:30 | 16 |
| 2022.03.11. 07:45 | 16 |
| 2022.03.11. 08:00 | 16 |
| 2022.03.11. 08:15 | 16 |
| 2022.03.11. 08:30 | 16 |
| 2022.03.11. 08:45 | 16 |
| 2022.03.11. 09:00 | 16 |
| 2022.03.11. 09:15 | 16 |
| 2022.03.11. 09:30 | 16 |
| 2022.03.11. 09:45 | 16 |
| 2022.03.11. 10:00 | 16 |
| 2022.03.11. 10:15 | 16 |
| 2022.03.11. 10:30 | 16 |
| 2022.03.11. 10:45 | 16 |
| 2022.03.11. 11:00 | 16 |
| 2022.03.11. 11:15 | 16 |
| 2022.03.11. 11:30 | 16 |
| 2022.03.11. 11:45 | 16 |
| 2022.03.11. 12:00 | 16 |
| 2022.03.11. 12:15 | 16 |
| 2022.03.11. 12:30 | 16 |
| 2022.03.11. 12:45 | 16 |
| 2022.03.11. 13:00 | 16 |
| 2022.03.11. 13:15 | 16 |
| 2022.03.11. 13:30 | 16 |
| 2022.03.11. 13:45 | 16 |
| 2022.03.11. 14:00 | 16 |
| 2022.03.11. 14:15 | 16 |
| 2022.03.11. 14:30 | 16 |
| 2022.03.11. 14:45 | 16 |
| 2022.03.11. 15:00 | 16 |
| 2022.03.11. 15:15 | 16 |
| 2022.03.11. 15:30 | 16 |
| 2022.03.11. 15:45 | 16 |
| 2022.03.11. 16:00 | 16 |
| 2022.03.11. 16:15 | 16 |
| 2022.03.11. 16:30 | 16 |
| 2022.03.11. 16:45 | 16 |
| 2022.03.11. 17:00 | 16 |
| 2022.03.11. 17:15 | 16 |
| 2022.03.11. 17:30 | 16 |
| 2022.03.11. 17:45 | 16 |
| 2022.03.11. 18:00 | 16 |
| 2022.03.11. 18:15 | 16 |
| 2022.03.11. 18:30 | 16 |
| 2022.03.11. 18:45 | 16 |
| 2022.03.11. 19:00 | 16 |
| 2022.03.11. 19:15 | 16 |
| 2022.03.11. 19:30 | 16 |
| 2022.03.11. 19:45 | 16 |
| 2022.03.11. 20:00 | 16 |
| 2022.03.11. 20:15 | 16 |
| 2022.03.11. 20:30 | 16 |
| 2022.03.11. 20:45 | 16 |
| 2022.03.11. 21:00 | 16 |
| 2022.03.11. 21:15 | 16 |
| 2022.03.11. 21:30 | 16 |
| 2022.03.11. 21:45 | 16 |
| 2022.03.11. 22:00 | 16 |
| 2022.03.11. 22:15 | 16 |
| 2022.03.11. 22:30 | 16 |
| 2022.03.11. 22:45 | 16 |
| 2022.03.11. 23:00 | 16 |
| 2022.03.11. 23:15 | 16 |
| 2022.03.11. 23:30 | 16 |
| 2022.03.11. 23:45 | 16 |
| 2022.03.12. 00:00 | 16 |
| 2022.03.12. 00:15 | 16 |
| 2022.03.12. 00:30 | 16 |
| 2022.03.12. 00:45 | 16 |
| 2022.03.12. 01:00 | 16 |
| 2022.03.12. 01:15 | 16 |
| 2022.03.12. 01:30 | 16 |
| 2022.03.12. 01:45 | 16 |
| 2022.03.12. 02:00 | 16 |
| 2022.03.12. 02:15 | 16 |
| 2022.03.12. 02:30 | 16 |
| 2022.03.12. 02:45 | 16 |
| 2022.03.12. 03:00 | 16 |
| 2022.03.12. 03:15 | 16 |
| 2022.03.12. 03:30 | 16 |
| 2022.03.12. 03:45 | 16 |
| 2022.03.12. 04:00 | 16 |
| 2022.03.12. 04:15 | 16 |
| 2022.03.12. 04:30 | 16 |
| 2022.03.12. 04:45 | 16 |
| 2022.03.12. 05:00 | 16 |
| 2022.03.12. 05:15 | 16 |
| 2022.03.12. 05:30 | 16 |
| 2022.03.12. 05:45 | 16 |
| 2022.03.12. 06:00 | 16 |
| 2022.03.12. 06:15 | 16 |
| 2022.03.12. 06:30 | 16 |
| 2022.03.12. 06:45 | 16 |
| 2022.03.12. 07:00 | 16 |
| 2022.03.12. 07:15 | 16 |
| 2022.03.12. 07:30 | 16 |
| 2022.03.12. 07:45 | 16 |
| 2022.03.12. 08:00 | 16 |
| 2022.03.12. 08:15 | 16 |
| 2022.03.12. 08:30 | 16 |
| 2022.03.12. 08:45 | 16 |
| 2022.03.12. 09:00 | 16 |
| 2022.03.12. 09:15 | 16 |
| 2022.03.12. 09:30 | 16 |
| 2022.03.12. 09:45 | 16 |
| 2022.03.12. 10:00 | 16 |
| 2022.03.12. 10:15 | 16 |
| 2022.03.12. 10:30 | 16 |
| 2022.03.12. 10:45 | 16 |
| 2022.03.12. 11:00 | 16 |
| 2022.03.12. 11:15 | 16 |
| 2022.03.12. 11:30 | 16 |
| 2022.03.12. 11:45 | 16 |
| 2022.03.12. 12:00 | 16 |
| 2022.03.12. 12:15 | 16 |
| 2022.03.12. 12:30 | 16 |
| 2022.03.12. 12:45 | 16 |
| 2022.03.12. 13:00 | 16 |
| 2022.03.12. 13:15 | 16 |
| 2022.03.12. 13:30 | 16 |
| 2022.03.12. 13:45 | 16 |
| 2022.03.12. 14:00 | 16 |
| 2022.03.12. 14:15 | 16 |
| 2022.03.12. 14:30 | 16 |
| 2022.03.12. 14:45 | 16 |
| 2022.03.12. 15:00 | 16 |
| 2022.03.12. 15:15 | 16 |
| 2022.03.12. 15:30 | 16 |
| 2022.03.12. 15:45 | 16 |
| 2022.03.12. 16:00 | 16 |
| 2022.03.12. 16:15 | 16 |
| 2022.03.12. 16:30 | 16 |
| 2022.03.12. 16:45 | 16 |
| 2022.03.12. 17:00 | 16 |
| 2022.03.12. 17:15 | 16 |
| 2022.03.12. 17:30 | 16 |
| 2022.03.12. 17:45 | 16 |
| 2022.03.12. 18:00 | 16 |
| 2022.03.12. 18:15 | 16 |
| 2022.03.12. 18:30 | 16 |
| 2022.03.12. 18:45 | 16 |
| 2022.03.12. 19:00 | 16 |
| 2022.03.12. 19:15 | 16 |
| 2022.03.12. 19:30 | 16 |
| 2022.03.12. 19:45 | 16 |
| 2022.03.12. 20:00 | 16 |
| 2022.03.12. 20:15 | 16 |
| 2022.03.12. 20:30 | 16 |
| 2022.03.12. 20:45 | 16 |
| 2022.03.12. 21:00 | 16 |
| 2022.03.12. 21:15 | 16 |
| 2022.03.12. 21:30 | 16 |
| 2022.03.12. 21:45 | 16 |
| 2022.03.12. 22:00 | 16 |
| 2022.03.12. 22:15 | 16 |
| 2022.03.12. 22:30 | 16 |
| 2022.03.12. 22:45 | 16 |
| 2022.03.12. 23:00 | 16 |
| 2022.03.12. 23:15 | 16 |
| 2022.03.12. 23:30 | 16 |
| 2022.03.12. 23:45 | 16 |
| 2022.03.13. 00:00 | 16 |
| 2022.03.13. 00:15 | 16 |
| 2022.03.13. 00:30 | 16 |
| 2022.03.13. 00:45 | 16 |
| 2022.03.13. 01:00 | 16 |
| 2022.03.13. 01:15 | 16 |
| 2022.03.13. 01:30 | 16 |
| 2022.03.13. 01:45 | 16 |
| 2022.03.13. 02:00 | 16 |
| 2022.03.13. 02:15 | 16 |
| 2022.03.13. 02:30 | 16 |
| 2022.03.13. 02:45 | 16 |
| 2022.03.13. 03:00 | 16 |
| 2022.03.13. 03:15 | 16 |
| 2022.03.13. 03:30 | 16 |
| 2022.03.13. 03:45 | 16 |
| 2022.03.13. 04:00 | 16 |
| 2022.03.13. 04:15 | 16 |
| 2022.03.13. 04:30 | 16 |
| 2022.03.13. 04:45 | 16 |
| 2022.03.13. 05:00 | 16 |
| 2022.03.13. 05:15 | 16 |
| 2022.03.13. 05:30 | 16 |
| 2022.03.13. 05:45 | 16 |
| 2022.03.13. 06:00 | 16 |
| 2022.03.13. 06:15 | 16 |
| 2022.03.13. 06:30 | 16 |
| 2022.03.13. 06:45 | 16 |
| 2022.03.13. 07:00 | 16 |
| 2022.03.13. 07:15 | 16 |
| 2022.03.13. 07:30 | 16 |
| 2022.03.13. 07:45 | 16 |
| 2022.03.13. 08:00 | 16 |
| 2022.03.13. 08:15 | 16 |
| 2022.03.13. 08:30 | 16 |
| 2022.03.13. 08:45 | 16 |
| 2022.03.13. 09:00 | 16 |
| 2022.03.13. 09:15 | 16 |
| 2022.03.13. 09:30 | 16 |
| 2022.03.13. 09:45 | 16 |
| 2022.03.13. 10:00 | 16 |
| 2022.03.13. 10:15 | 16 |
| 2022.03.13. 10:30 | 16 |
| 2022.03.13. 10:45 | 16 |
| 2022.03.13. 11:00 | 16 |
| 2022.03.13. 11:15 | 16 |
| 2022.03.13. 11:30 | 16 |
| 2022.03.13. 11:45 | 16 |
| 2022.03.13. 12:00 | 16 |
| 2022.03.13. 12:15 | 16 |
| 2022.03.13. 12:30 | 16 |
| 2022.03.13. 12:45 | 16 |
| 2022.03.13. 13:00 | 16 |
| 2022.03.13. 13:15 | 16 |
| 2022.03.13. 13:30 | 16 |
| 2022.03.13. 13:45 | 16 |
| 2022.03.13. 14:00 | 16 |
| 2022.03.13. 14:15 | 16 |
| 2022.03.13. 14:30 | 16 |
| 2022.03.13. 14:45 | 16 |
| 2022.03.13. 15:00 | 16 |
| 2022.03.13. 15:15 | 16 |
| 2022.03.13. 15:30 | 16 |
| 2022.03.13. 15:45 | 16 |
| 2022.03.13. 16:00 | 16 |
| 2022.03.13. 16:15 | 16 |
| 2022.03.13. 16:30 | 16 |
| 2022.03.13. 16:45 | 16 |
| 2022.03.13. 17:00 | 16 |
| 2022.03.13. 17:15 | 16 |
| 2022.03.13. 17:30 | 16 |
| 2022.03.13. 17:45 | 16 |
| 2022.03.13. 18:00 | 16 |
| 2022.03.13. 18:15 | 16 |
| 2022.03.13. 18:30 | 16 |
| 2022.03.13. 18:45 | 16 |
| 2022.03.13. 19:00 | 16 |
| 2022.03.13. 19:15 | 16 |
| 2022.03.13. 19:30 | 16 |
| 2022.03.13. 19:45 | 16 |
| 2022.03.13. 20:00 | 16 |
| 2022.03.13. 20:15 | 16 |
| 2022.03.13. 20:30 | 16 |
| 2022.03.13. 20:45 | 16 |
| 2022.03.13. 21:00 | 16 |
| 2022.03.13. 21:15 | 16 |
| 2022.03.13. 21:30 | 16 |
| 2022.03.13. 21:45 | 16 |
| 2022.03.13. 22:00 | 16 |
| 2022.03.13. 22:15 | 16 |
| 2022.03.13. 22:30 | 16 |
| 2022.03.13. 22:45 | 16 |
| 2022.03.13. 23:00 | 16 |
| 2022.03.13. 23:15 | 16 |
| 2022.03.13. 23:30 | 16 |
| 2022.03.13. 23:45 | 16 |
| 2022.03.14. 00:00 | 16 |
| 2022.03.14. 00:15 | 16 |
| 2022.03.14. 00:30 | 16 |
| 2022.03.14. 00:45 | 16 |
| 2022.03.14. 01:00 | 16 |
| 2022.03.14. 01:15 | 16 |
| 2022.03.14. 01:30 | 16 |
| 2022.03.14. 01:45 | 16 |
| 2022.03.14. 02:00 | 16 |
| 2022.03.14. 02:15 | 16 |
| 2022.03.14. 02:30 | 16 |
| 2022.03.14. 02:45 | 16 |
| 2022.03.14. 03:00 | 16 |
| 2022.03.14. 03:15 | 16 |
| 2022.03.14. 03:30 | 16 |
| 2022.03.14. 03:45 | 16 |
| 2022.03.14. 04:00 | 16 |
| 2022.03.14. 04:15 | 16 |
| 2022.03.14. 04:30 | 16 |
| 2022.03.14. 04:45 | 16 |
| 2022.03.14. 05:00 | 16 |
| 2022.03.14. 05:15 | 16 |
| 2022.03.14. 05:30 | 16 |
| 2022.03.14. 05:45 | 16 |
| 2022.03.14. 06:00 | 16 |
| 2022.03.14. 06:15 | 16 |
| 2022.03.14. 06:30 | 16 |
| 2022.03.14. 06:45 | 16 |
| 2022.03.14. 07:00 | 16 |
| 2022.03.14. 07:15 | 16 |
| 2022.03.14. 07:30 | 16 |
| 2022.03.14. 07:45 | 16 |
| 2022.03.14. 08:00 | 16 |
| 2022.03.14. 08:15 | 16 |
| 2022.03.14. 08:30 | 16 |
| 2022.03.14. 08:45 | 16 |
| 2022.03.14. 09:00 | 16 |
| 2022.03.14. 09:15 | 16 |
| 2022.03.14. 09:30 | 16 |
| 2022.03.14. 09:45 | 16 |
| 2022.03.14. 10:00 | 16 |
| 2022.03.14. 10:15 | 16 |
| 2022.03.14. 10:30 | 16 |
| 2022.03.14. 10:45 | 16 |
| 2022.03.14. 11:00 | 16 |
| 2022.03.14. 11:15 | 16 |
| 2022.03.14. 11:30 | 16 |
| 2022.03.14. 11:45 | 16 |
| 2022.03.14. 12:00 | 16 |
| 2022.03.14. 12:15 | 16 |
| 2022.03.14. 12:30 | 16 |
| 2022.03.14. 12:45 | 16 |
| 2022.03.14. 13:00 | 16 |
| 2022.03.14. 13:15 | 16 |
| 2022.03.14. 13:30 | 16 |
| 2022.03.14. 13:45 | 16 |
| 2022.03.14. 14:00 | 16 |
| 2022.03.14. 14:15 | 16 |
| 2022.03.14. 14:30 | 16 |
| 2022.03.14. 14:45 | 16 |
| 2022.03.14. 15:00 | 16 |
| 2022.03.14. 15:15 | 16 |
| 2022.03.14. 15:30 | 16 |
| 2022.03.14. 15:45 | 16 |
| 2022.03.14. 16:00 | 16 |
| 2022.03.14. 16:15 | 16 |
| 2022.03.14. 16:30 | 16 |
| 2022.03.14. 16:45 | 16 |
| 2022.03.14. 17:00 | 16 |
| 2022.03.14. 17:15 | 16 |
| 2022.03.14. 17:30 | 16 |
| 2022.03.14. 17:45 | 16 |
| 2022.03.14. 18:00 | 16 |
| 2022.03.14. 18:15 | 16 |
| 2022.03.14. 18:30 | 16 |
| 2022.03.14. 18:45 | 16 |
| 2022.03.14. 19:00 | 16 |
| 2022.03.14. 19:15 | 16 |
| 2022.03.14. 19:30 | 16 |
| 2022.03.14. 19:45 | 16 |
| 2022.03.14. 20:00 | 16 |
| 2022.03.14. 20:15 | 16 |
| 2022.03.14. 20:30 | 16 |
| 2022.03.14. 20:45 | 16 |
| 2022.03.14. 21:00 | 16 |
| 2022.03.14. 21:15 | 16 |
| 2022.03.14. 21:30 | 16 |
| 2022.03.14. 21:45 | 16 |
| 2022.03.14. 22:00 | 16 |
| 2022.03.14. 22:15 | 16 |
| 2022.03.14. 22:30 | 16 |
| 2022.03.14. 22:45 | 16 |
| 2022.03.14. 23:00 | 16 |
| 2022.03.14. 23:15 | 16 |
| 2022.03.14. 23:30 | 16 |
| 2022.03.14. 23:45 | 16 |
| 2022.03.15. 00:00 | 16 |
| 2022.03.15. 00:15 | 16 |
| 2022.03.15. 00:30 | 16 |
| 2022.03.15. 00:45 | 16 |
| 2022.03.15. 01:00 | 16 |
| 2022.03.15. 01:15 | 16 |
| 2022.03.15. 01:30 | 16 |
| 2022.03.15. 01:45 | 16 |
| 2022.03.15. 02:00 | 16 |
| 2022.03.15. 02:15 | 16 |
| 2022.03.15. 02:30 | 16 |
| 2022.03.15. 02:45 | 16 |
| 2022.03.15. 03:00 | 16 |
| 2022.03.15. 03:15 | 16 |
| 2022.03.15. 03:30 | 16 |
| 2022.03.15. 03:45 | 16 |
| 2022.03.15. 04:00 | 16 |
| 2022.03.15. 04:15 | 16 |
| 2022.03.15. 04:30 | 16 |
| 2022.03.15. 04:45 | 16 |
| 2022.03.15. 05:00 | 16 |
| 2022.03.15. 05:15 | 16 |
| 2022.03.15. 05:30 | 16 |
| 2022.03.15. 05:45 | 16 |
| 2022.03.15. 06:00 | 16 |
| 2022.03.15. 06:15 | 16 |
| 2022.03.15. 06:30 | 16 |
| 2022.03.15. 06:45 | 16 |
| 2022.03.15. 07:00 | 16 |
| 2022.03.15. 07:15 | 16 |
| 2022.03.15. 07:30 | 16 |
| 2022.03.15. 07:45 | 16 |
| 2022.03.15. 08:00 | 16 |
| 2022.03.15. 08:15 | 16 |
| 2022.03.15. 08:30 | 16 |
| 2022.03.15. 08:45 | 16 |
| 2022.03.15. 09:00 | 16 |
| 2022.03.15. 09:15 | 16 |
| 2022.03.15. 09:30 | 16 |
| 2022.03.15. 09:45 | 16 |
| 2022.03.15. 10:00 | 16 |
| 2022.03.15. 10:15 | 16 |
| 2022.03.15. 10:30 | 16 |
| 2022.03.15. 10:45 | 16 |
| 2022.03.15. 11:00 | 16 |
| 2022.03.15. 11:15 | 16 |
| 2022.03.15. 11:30 | 16 |
| 2022.03.15. 11:45 | 16 |
| 2022.03.15. 12:00 | 16 |
| 2022.03.15. 12:15 | 16 |
| 2022.03.15. 12:30 | 16 |
| 2022.03.15. 12:45 | 16 |
| 2022.03.15. 13:00 | 16 |
| 2022.03.15. 13:15 | 16 |
| 2022.03.15. 13:30 | 16 |
| 2022.03.15. 13:45 | 16 |
| 2022.03.15. 14:00 | 16 |
| 2022.03.15. 14:15 | 16 |
| 2022.03.15. 14:30 | 16 |
| 2022.03.15. 14:45 | 16 |
| 2022.03.15. 15:00 | 16 |
| 2022.03.15. 15:15 | 16 |
| 2022.03.15. 15:30 | 16 |
| 2022.03.15. 15:45 | 16 |
| 2022.03.15. 16:00 | 16 |
| 2022.03.15. 16:15 | 16 |
| 2022.03.15. 16:30 | 16 |
| 2022.03.15. 16:45 | 16 |
| 2022.03.15. 17:00 | 16 |
| 2022.03.15. 17:15 | 16 |
| 2022.03.15. 17:30 | 16 |
| 2022.03.15. 17:45 | 16 |
| 2022.03.15. 18:00 | 16 |
| 2022.03.15. 18:15 | 16 |
| 2022.03.15. 18:30 | 16 |
| 2022.03.15. 18:45 | 16 |
| 2022.03.15. 19:00 | 16 |
| 2022.03.15. 19:15 | 16 |
| 2022.03.15. 19:30 | 16 |
| 2022.03.15. 19:45 | 16 |
| 2022.03.15. 20:00 | 16 |
| 2022.03.15. 20:15 | 16 |
| 2022.03.15. 20:30 | 16 |
| 2022.03.15. 20:45 | 16 |
| 2022.03.15. 21:00 | 16 |
| 2022.03.15. 21:15 | 16 |
| 2022.03.15. 21:30 | 16 |
| 2022.03.15. 21:45 | 16 |
| 2022.03.15. 22:00 | 16 |
| 2022.03.15. 22:15 | 16 |
| 2022.03.15. 22:30 | 16 |
| 2022.03.15. 22:45 | 16 |
| 2022.03.15. 23:00 | 16 |
| 2022.03.15. 23:15 | 16 |
| 2022.03.15. 23:30 | 16 |
| 2022.03.15. 23:45 | 16 |
| 2022.03.16. 00:00 | 16 |
| 2022.03.16. 00:15 | 16 |
| 2022.03.16. 00:30 | 16 |
| 2022.03.16. 00:45 | 16 |
| 2022.03.16. 01:00 | 16 |
| 2022.03.16. 01:15 | 16 |
| 2022.03.16. 01:30 | 16 |
| 2022.03.16. 01:45 | 16 |
| 2022.03.16. 02:00 | 16 |
| 2022.03.16. 02:15 | 16 |
| 2022.03.16. 02:30 | 16 |
| 2022.03.16. 02:45 | 16 |
| 2022.03.16. 03:00 | 16 |
| 2022.03.16. 03:15 | 16 |
| 2022.03.16. 03:30 | 16 |
| 2022.03.16. 03:45 | 16 |
| 2022.03.16. 04:00 | 16 |
| 2022.03.16. 04:15 | 16 |
| 2022.03.16. 04:30 | 16 |
| 2022.03.16. 04:45 | 16 |
| 2022.03.16. 05:00 | 16 |
| 2022.03.16. 05:15 | 16 |
| 2022.03.16. 05:30 | 16 |
| 2022.03.16. 05:45 | 16 |
| 2022.03.16. 06:00 | 16 |
| 2022.03.16. 06:15 | 16 |
| 2022.03.16. 06:30 | 16 |
| 2022.03.16. 06:45 | 16 |
| 2022.03.16. 07:00 | 16 |
| 2022.03.16. 07:15 | 16 |
| 2022.03.16. 07:30 | 16 |
| 2022.03.16. 07:45 | 16 |
| 2022.03.16. 08:00 | 16 |
| 2022.03.16. 08:15 | 16 |
| 2022.03.16. 08:30 | 16 |
| 2022.03.16. 08:45 | 16 |
| 2022.03.16. 09:00 | 16 |
| 2022.03.16. 09:15 | 16 |
| 2022.03.16. 09:30 | 16 |
| 2022.03.16. 09:45 | 16 |
| 2022.03.16. 10:00 | 16 |
| 2022.03.16. 10:15 | 16 |
| 2022.03.16. 10:30 | 16 |
| 2022.03.16. 10:45 | 16 |
| 2022.03.16. 11:00 | 16 |
| 2022.03.16. 11:15 | 16 |
| 2022.03.16. 11:30 | 16 |
| 2022.03.16. 11:45 | 16 |
| 2022.03.16. 12:00 | 16 |
| 2022.03.16. 12:15 | 16 |
| 2022.03.16. 12:30 | 16 |
| 2022.03.16. 12:45 | 16 |
| 2022.03.16. 13:00 | 16 |
| 2022.03.16. 13:15 | 16 |
| 2022.03.16. 13:30 | 16 |
| 2022.03.16. 13:45 | 16 |
| 2022.03.16. 14:00 | 16 |
| 2022.03.16. 14:15 | 16 |
| 2022.03.16. 14:30 | 16 |
| 2022.03.16. 14:45 | 16 |
| 2022.03.16. 15:00 | 16 |
| 2022.03.16. 15:15 | 16 |
| 2022.03.16. 15:30 | 16 |
| 2022.03.16. 15:45 | 16 |
| 2022.03.16. 16:00 | 16 |
| 2022.03.16. 16:15 | 16 |
| 2022.03.16. 16:30 | 16 |
| 2022.03.16. 16:45 | 16 |
| 2022.03.16. 17:00 | 16 |
| 2022.03.16. 17:15 | 16 |
| 2022.03.16. 17:30 | 16 |
| 2022.03.16. 17:45 | 16 |
| 2022.03.16. 18:00 | 16 |
| 2022.03.16. 18:15 | 16 |
| 2022.03.16. 18:30 | 16 |
| 2022.03.16. 18:45 | 16 |
| 2022.03.16. 19:00 | 16 |
| 2022.03.16. 19:15 | 16 |
| 2022.03.16. 19:30 | 16 |
| 2022.03.16. 19:45 | 16 |
| 2022.03.16. 20:00 | 16 |
| 2022.03.16. 20:15 | 16 |
| 2022.03.16. 20:30 | 16 |
| 2022.03.16. 20:45 | 16 |
| 2022.03.16. 21:00 | 16 |
| 2022.03.16. 21:15 | 16 |
| 2022.03.16. 21:30 | 16 |
| 2022.03.16. 21:45 | 16 |
| 2022.03.16. 22:00 | 16 |
| 2022.03.16. 22:15 | 16 |
| 2022.03.16. 22:30 | 16 |
| 2022.03.16. 22:45 | 16 |
| 2022.03.16. 23:00 | 16 |
| 2022.03.16. 23:15 | 16 |
| 2022.03.16. 23:30 | 16 |
| 2022.03.16. 23:45 | 16 |
| 2022.03.17. 00:00 | 16 |
| 2022.03.17. 00:15 | 16 |
| 2022.03.17. 00:30 | 16 |
| 2022.03.17. 00:45 | 16 |
| 2022.03.17. 01:00 | 16 |
| 2022.03.17. 01:15 | 16 |
| 2022.03.17. 01:30 | 16 |
| 2022.03.17. 01:45 | 16 |
| 2022.03.17. 02:00 | 16 |
| 2022.03.17. 02:15 | 16 |
| 2022.03.17. 02:30 | 16 |
| 2022.03.17. 02:45 | 16 |
| 2022.03.17. 03:00 | 16 |
| 2022.03.17. 03:15 | 16 |
| 2022.03.17. 03:30 | 16 |
| 2022.03.17. 03:45 | 16 |
| 2022.03.17. 04:00 | 16 |
| 2022.03.17. 04:15 | 16 |
| 2022.03.17. 04:30 | 16 |
| 2022.03.17. 04:45 | 16 |
| 2022.03.17. 05:00 | 16 |
| 2022.03.17. 05:15 | 16 |
| 2022.03.17. 05:30 | 16 |
| 2022.03.17. 05:45 | 16 |
| 2022.03.17. 06:00 | 16 |
| 2022.03.17. 06:15 | 16 |
| 2022.03.17. 06:30 | 16 |
| 2022.03.17. 06:45 | 16 |
| 2022.03.17. 07:00 | 16 |
| 2022.03.17. 07:15 | 16 |
| 2022.03.17. 07:30 | 16 |
| 2022.03.17. 07:45 | 16 |
| 2022.03.17. 08:00 | 16 |
| 2022.03.17. 08:15 | 16 |
| 2022.03.17. 08:30 | 16 |
| 2022.03.17. 08:45 | 16 |
| 2022.03.17. 09:00 | 16 |
| 2022.03.17. 09:15 | 16 |
| 2022.03.17. 09:30 | 16 |
| 2022.03.17. 09:45 | 16 |
| 2022.03.17. 10:00 | 16 |
| 2022.03.17. 10:15 | 16 |
| 2022.03.17. 10:30 | 16 |
| 2022.03.17. 10:45 | 16 |
| 2022.03.17. 11:00 | 16 |
| 2022.03.17. 11:15 | 16 |
| 2022.03.17. 11:30 | 16 |
| 2022.03.17. 11:45 | 16 |
| 2022.03.17. 12:00 | 16 |
| 2022.03.17. 12:15 | 16 |
| 2022.03.17. 12:30 | 16 |
| 2022.03.17. 12:45 | 16 |
| 2022.03.17. 13:00 | 16 |
| 2022.03.17. 13:15 | 16 |
| 2022.03.17. 13:30 | 16 |
| 2022.03.17. 13:45 | 16 |
| 2022.03.17. 14:00 | 16 |
| 2022.03.17. 14:15 | 16 |
| 2022.03.17. 14:30 | 16 |
| 2022.03.17. 14:45 | 16 |
| 2022.03.17. 15:00 | 16 |
| 2022.03.17. 15:15 | 16 |
| 2022.03.17. 15:30 | 16 |
| 2022.03.17. 15:45 | 16 |
| 2022.03.17. 16:00 | 16 |
| 2022.03.17. 16:15 | 16 |
| 2022.03.17. 16:30 | 16 |
| 2022.03.17. 16:45 | 16 |
| 2022.03.17. 17:00 | 16 |
| 2022.03.17. 17:15 | 16 |
| 2022.03.17. 17:30 | 16 |
| 2022.03.17. 17:45 | 16 |
| 2022.03.17. 18:00 | 16 |
| 2022.03.17. 18:15 | 16 |
| 2022.03.17. 18:30 | 16 |
| 2022.03.17. 18:45 | 16 |
| 2022.03.17. 19:00 | 16 |
| 2022.03.17. 19:15 | 16 |
| 2022.03.17. 19:30 | 16 |
| 2022.03.17. 19:45 | 16 |
| 2022.03.17. 20:00 | 16 |
| 2022.03.17. 20:15 | 16 |
| 2022.03.17. 20:30 | 16 |
| 2022.03.17. 20:45 | 16 |
| 2022.03.17. 21:00 | 16 |
| 2022.03.17. 21:15 | 16 |
| 2022.03.17. 21:30 | 16 |
| 2022.03.17. 21:45 | 16 |
| 2022.03.17. 22:00 | 16 |
| 2022.03.17. 22:15 | 16 |
| 2022.03.17. 22:30 | 16 |
| 2022.03.17. 22:45 | 16 |
| 2022.03.17. 23:00 | 16 |
| 2022.03.17. 23:15 | 16 |
| 2022.03.17. 23:30 | 16 |
| 2022.03.17. 23:45 | 16 |
| 2022.03.18. 00:00 | 16 |
| 2022.03.18. 00:15 | 16 |
| 2022.03.18. 00:30 | 16 |
| 2022.03.18. 00:45 | 16 |
| 2022.03.18. 01:00 | 16 |
| 2022.03.18. 01:15 | 16 |
| 2022.03.18. 01:30 | 16 |
| 2022.03.18. 01:45 | 16 |
| 2022.03.18. 02:00 | 16 |
| 2022.03.18. 02:15 | 16 |
| 2022.03.18. 02:30 | 16 |
| 2022.03.18. 02:45 | 16 |
| 2022.03.18. 03:00 | 16 |
| 2022.03.18. 03:15 | 16 |
| 2022.03.18. 03:30 | 16 |
| 2022.03.18. 03:45 | 16 |
| 2022.03.18. 04:00 | 16 |
| 2022.03.18. 04:15 | 16 |
| 2022.03.18. 04:30 | 16 |
| 2022.03.18. 04:45 | 16 |
| 2022.03.18. 05:00 | 16 |
| 2022.03.18. 05:15 | 16 |
| 2022.03.18. 05:30 | 16 |
| 2022.03.18. 05:45 | 16 |
| 2022.03.18. 06:00 | 16 |
| 2022.03.18. 06:15 | 16 |
| 2022.03.18. 06:30 | 16 |
| 2022.03.18. 06:45 | 16 |
| 2022.03.18. 07:00 | 16 |
| 2022.03.18. 07:15 | 16 |
| 2022.03.18. 07:30 | 16 |
| 2022.03.18. 07:45 | 16 |
| 2022.03.18. 08:00 | 16 |
| 2022.03.18. 08:15 | 16 |
| 2022.03.18. 08:30 | 16 |
| 2022.03.18. 08:45 | 16 |
| 2022.03.18. 09:00 | 16 |
| 2022.03.18. 09:15 | 16 |
| 2022.03.18. 09:30 | 16 |
| 2022.03.18. 09:45 | 16 |
| 2022.03.18. 10:00 | 16 |
| 2022.03.18. 10:15 | 16 |
| 2022.03.18. 10:30 | 16 |
| 2022.03.18. 10:45 | 16 |
| 2022.03.18. 11:00 | 16 |
| 2022.03.18. 11:15 | 16 |
| 2022.03.18. 11:30 | 16 |
| 2022.03.18. 11:45 | 16 |
| 2022.03.18. 12:00 | 16 |
| 2022.03.18. 12:15 | 16 |
| 2022.03.18. 12:30 | 16 |
| 2022.03.18. 12:45 | 16 |
| 2022.03.18. 13:00 | 16 |
| 2022.03.18. 13:15 | 16 |
| 2022.03.18. 13:30 | 16 |
| 2022.03.18. 13:45 | 16 |
| 2022.03.18. 14:00 | 16 |
| 2022.03.18. 14:15 | 16 |
| 2022.03.18. 14:30 | 16 |
| 2022.03.18. 14:45 | 16 |
| 2022.03.18. 15:00 | 16 |
| 2022.03.18. 15:15 | 16 |
| 2022.03.18. 15:30 | 16 |
| 2022.03.18. 15:45 | 16 |
| 2022.03.18. 16:00 | 16 |
| 2022.03.18. 16:15 | 16 |
| 2022.03.18. 16:30 | 16 |
| 2022.03.18. 16:45 | 16 |
| 2022.03.18. 17:00 | 16 |
| 2022.03.18. 17:15 | 16 |
| 2022.03.18. 17:30 | 16 |
| 2022.03.18. 17:45 | 16 |
| 2022.03.18. 18:00 | 16 |
| 2022.03.18. 18:15 | 16 |
| 2022.03.18. 18:30 | 16 |
| 2022.03.18. 18:45 | 16 |
| 2022.03.18. 19:00 | 16 |
| 2022.03.18. 19:15 | 16 |
| 2022.03.18. 19:30 | 16 |
| 2022.03.18. 19:45 | 16 |
| 2022.03.18. 20:00 | 16 |
| 2022.03.18. 20:15 | 16 |
| 2022.03.18. 20:30 | 16 |
| 2022.03.18. 20:45 | 16 |
| 2022.03.18. 21:00 | 16 |
| 2022.03.18. 21:15 | 16 |
| 2022.03.18. 21:30 | 16 |
| 2022.03.18. 21:45 | 16 |
| 2022.03.18. 22:00 | 16 |
| 2022.03.18. 22:15 | 16 |
| 2022.03.18. 22:30 | 16 |
| 2022.03.18. 22:45 | 16 |
| 2022.03.18. 23:00 | 16 |
| 2022.03.18. 23:15 | 16 |
| 2022.03.18. 23:30 | 16 |
| 2022.03.18. 23:45 | 16 |
| 2022.03.19. 00:00 | 16 |
| 2022.03.19. 00:15 | 16 |
| 2022.03.19. 00:30 | 16 |
| 2022.03.19. 00:45 | 16 |
| 2022.03.19. 01:00 | 16 |
| 2022.03.19. 01:15 | 16 |
| 2022.03.19. 01:30 | 16 |
| 2022.03.19. 01:45 | 16 |
| 2022.03.19. 02:00 | 16 |
| 2022.03.19. 02:15 | 16 |
| 2022.03.19. 02:30 | 16 |
| 2022.03.19. 02:45 | 16 |
| 2022.03.19. 03:00 | 16 |
| 2022.03.19. 03:15 | 16 |
| 2022.03.19. 03:30 | 16 |
| 2022.03.19. 03:45 | 16 |
| 2022.03.19. 04:00 | 16 |
| 2022.03.19. 04:15 | 16 |
| 2022.03.19. 04:30 | 16 |
| 2022.03.19. 04:45 | 16 |
| 2022.03.19. 05:00 | 16 |
| 2022.03.19. 05:15 | 16 |
| 2022.03.19. 05:30 | 16 |
| 2022.03.19. 05:45 | 16 |
| 2022.03.19. 06:00 | 16 |
| 2022.03.19. 06:15 | 16 |
| 2022.03.19. 06:30 | 16 |
| 2022.03.19. 06:45 | 16 |
| 2022.03.19. 07:00 | 16 |
| 2022.03.19. 07:15 | 16 |
| 2022.03.19. 07:30 | 16 |
| 2022.03.19. 07:45 | 16 |
| 2022.03.19. 08:00 | 16 |
| 2022.03.19. 08:15 | 16 |
| 2022.03.19. 08:30 | 16 |
| 2022.03.19. 08:45 | 16 |
| 2022.03.19. 09:00 | 16 |
| 2022.03.19. 09:15 | 16 |
| 2022.03.19. 09:30 | 16 |
| 2022.03.19. 09:45 | 16 |
| 2022.03.19. 10:00 | 16 |
| 2022.03.19. 10:15 | 16 |
| 2022.03.19. 10:30 | 16 |
| 2022.03.19. 10:45 | 16 |
| 2022.03.19. 11:00 | 16 |
| 2022.03.19. 11:15 | 16 |
| 2022.03.19. 11:30 | 16 |
| 2022.03.19. 11:45 | 16 |
| 2022.03.19. 12:00 | 16 |
| 2022.03.19. 12:15 | 16 |
| 2022.03.19. 12:30 | 16 |
| 2022.03.19. 12:45 | 16 |
| 2022.03.19. 13:00 | 16 |
| 2022.03.19. 13:15 | 16 |
| 2022.03.19. 13:30 | 16 |
| 2022.03.19. 13:45 | 16 |
| 2022.03.19. 14:00 | 16 |
| 2022.03.19. 14:15 | 16 |
| 2022.03.19. 14:30 | 16 |
| 2022.03.19. 14:45 | 16 |
| 2022.03.19. 15:00 | 16 |
| 2022.03.19. 15:15 | 16 |
| 2022.03.19. 15:30 | 16 |
| 2022.03.19. 15:45 | 16 |
| 2022.03.19. 16:00 | 16 |
| 2022.03.19. 16:15 | 16 |
| 2022.03.19. 16:30 | 16 |
| 2022.03.19. 16:45 | 16 |
| 2022.03.19. 17:00 | 16 |
| 2022.03.19. 17:15 | 16 |
| 2022.03.19. 17:30 | 16 |
| 2022.03.19. 17:45 | 16 |
| 2022.03.19. 18:00 | 16 |
| 2022.03.19. 18:15 | 16 |
| 2022.03.19. 18:30 | 16 |
| 2022.03.19. 18:45 | 16 |
| 2022.03.19. 19:00 | 16 |
| 2022.03.19. 19:15 | 16 |
| 2022.03.19. 19:30 | 16 |
| 2022.03.19. 19:45 | 16 |
| 2022.03.19. 20:00 | 16 |
| 2022.03.19. 20:15 | 16 |
| 2022.03.19. 20:30 | 16 |
| 2022.03.19. 20:45 | 16 |
| 2022.03.19. 21:00 | 16 |
| 2022.03.19. 21:15 | 16 |
| 2022.03.19. 21:30 | 16 |
| 2022.03.19. 21:45 | 16 |
| 2022.03.19. 22:00 | 16 |
| 2022.03.19. 22:15 | 16 |
| 2022.03.19. 22:30 | 16 |
| 2022.03.19. 22:45 | 16 |
| 2022.03.19. 23:00 | 16 |
| 2022.03.19. 23:15 | 16 |
| 2022.03.19. 23:30 | 16 |
| 2022.03.19. 23:45 | 16 |
| 2022.03.20. 00:00 | 16 |
| 2022.03.20. 00:15 | 16 |
| 2022.03.20. 00:30 | 16 |
| 2022.03.20. 00:45 | 16 |
| 2022.03.20. 01:00 | 16 |
| 2022.03.20. 01:15 | 16 |
| 2022.03.20. 01:30 | 16 |
| 2022.03.20. 01:45 | 16 |
| 2022.03.20. 02:00 | 16 |
| 2022.03.20. 02:15 | 16 |
| 2022.03.20. 02:30 | 16 |
| 2022.03.20. 02:45 | 16 |
| 2022.03.20. 03:00 | 16 |
| 2022.03.20. 03:15 | 16 |
| 2022.03.20. 03:30 | 16 |
| 2022.03.20. 03:45 | 16 |
| 2022.03.20. 04:00 | 16 |
| 2022.03.20. 04:15 | 16 |
| 2022.03.20. 04:30 | 16 |
| 2022.03.20. 04:45 | 16 |
| 2022.03.20. 05:00 | 16 |
| 2022.03.20. 05:15 | 16 |
| 2022.03.20. 05:30 | 16 |
| 2022.03.20. 05:45 | 16 |
| 2022.03.20. 06:00 | 16 |
| 2022.03.20. 06:15 | 16 |
| 2022.03.20. 06:30 | 16 |
| 2022.03.20. 06:45 | 16 |
| 2022.03.20. 07:00 | 16 |
| 2022.03.20. 07:15 | 16 |
| 2022.03.20. 07:30 | 16 |
| 2022.03.20. 07:45 | 16 |
| 2022.03.20. 08:00 | 16 |
| 2022.03.20. 08:15 | 16 |
| 2022.03.20. 08:30 | 16 |
| 2022.03.20. 08:45 | 16 |
| 2022.03.20. 09:00 | 16 |
| 2022.03.20. 09:15 | 16 |
| 2022.03.20. 09:30 | 16 |
| 2022.03.20. 09:45 | 16 |
| 2022.03.20. 10:00 | 16 |
| 2022.03.20. 10:15 | 16 |
| 2022.03.20. 10:30 | 16 |
| 2022.03.20. 10:45 | 16 |
| 2022.03.20. 11:00 | 16 |
| 2022.03.20. 11:15 | 16 |
| 2022.03.20. 11:30 | 16 |
| 2022.03.20. 11:45 | 16 |
| 2022.03.20. 12:00 | 16 |
| 2022.03.20. 12:15 | 16 |
| 2022.03.20. 12:30 | 16 |
| 2022.03.20. 12:45 | 16 |
| 2022.03.20. 13:00 | 16 |
| 2022.03.20. 13:15 | 16 |
| 2022.03.20. 13:30 | 16 |
| 2022.03.20. 13:45 | 16 |
| 2022.03.20. 14:00 | 16 |
| 2022.03.20. 14:15 | 16 |
| 2022.03.20. 14:30 | 16 |
| 2022.03.20. 14:45 | 16 |
| 2022.03.20. 15:00 | 16 |
| 2022.03.20. 15:15 | 16 |
| 2022.03.20. 15:30 | 16 |
| 2022.03.20. 15:45 | 16 |
| 2022.03.20. 16:00 | 16 |
| 2022.03.20. 16:15 | 16 |
| 2022.03.20. 16:30 | 16 |
| 2022.03.20. 16:45 | 16 |
| 2022.03.20. 17:00 | 16 |
| 2022.03.20. 17:15 | 16 |
| 2022.03.20. 17:30 | 16 |
| 2022.03.20. 17:45 | 16 |
| 2022.03.20. 18:00 | 16 |
| 2022.03.20. 18:15 | 16 |
| 2022.03.20. 18:30 | 16 |
| 2022.03.20. 18:45 | 16 |
| 2022.03.20. 19:00 | 16 |
| 2022.03.20. 19:15 | 16 |
| 2022.03.20. 19:30 | 16 |
| 2022.03.20. 19:45 | 16 |
| 2022.03.20. 20:00 | 16 |
| 2022.03.20. 20:15 | 16 |
| 2022.03.20. 20:30 | 16 |
| 2022.03.20. 20:45 | 16 |
| 2022.03.20. 21:00 | 16 |
| 2022.03.20. 21:15 | 16 |
| 2022.03.20. 21:30 | 16 |
| 2022.03.20. 21:45 | 16 |
| 2022.03.20. 22:00 | 16 |
| 2022.03.20. 22:15 | 16 |
| 2022.03.20. 22:30 | 16 |
| 2022.03.20. 22:45 | 16 |
| 2022.03.20. 23:00 | 16 |
| 2022.03.20. 23:15 | 16 |
| 2022.03.20. 23:30 | 16 |
| 2022.03.20. 23:45 | 16 |
| 2022.03.21. 00:00 | 16 |
| 2022.03.21. 00:15 | 16 |
| 2022.03.21. 00:30 | 16 |
| 2022.03.21. 00:45 | 16 |
| 2022.03.21. 01:00 | 16 |
| 2022.03.21. 01:15 | 16 |
| 2022.03.21. 01:30 | 16 |
| 2022.03.21. 01:45 | 16 |
| 2022.03.21. 02:00 | 16 |
| 2022.03.21. 02:15 | 16 |
| 2022.03.21. 02:30 | 16 |
| 2022.03.21. 02:45 | 16 |
| 2022.03.21. 03:00 | 16 |
| 2022.03.21. 03:15 | 16 |
| 2022.03.21. 03:30 | 16 |
| 2022.03.21. 03:45 | 16 |
| 2022.03.21. 04:00 | 16 |
| 2022.03.21. 04:15 | 16 |
| 2022.03.21. 04:30 | 16 |
| 2022.03.21. 04:45 | 16 |
| 2022.03.21. 05:00 | 16 |
| 2022.03.21. 05:15 | 16 |
| 2022.03.21. 05:30 | 16 |
| 2022.03.21. 05:45 | 16 |
| 2022.03.21. 06:00 | 16 |
| 2022.03.21. 06:15 | 16 |
| 2022.03.21. 06:30 | 16 |
| 2022.03.21. 06:45 | 16 |
| 2022.03.21. 07:00 | 16 |
| 2022.03.21. 07:15 | 16 |
| 2022.03.21. 07:30 | 16 |
| 2022.03.21. 07:45 | 16 |
| 2022.03.21. 08:00 | 16 |
| 2022.03.21. 08:15 | 16 |
| 2022.03.21. 08:30 | 16 |
| 2022.03.21. 08:45 | 16 |
| 2022.03.21. 09:00 | 16 |
| 2022.03.21. 09:15 | 16 |
| 2022.03.21. 09:30 | 16 |
| 2022.03.21. 09:45 | 16 |
| 2022.03.21. 10:00 | 16 |
| 2022.03.21. 10:15 | 16 |
| 2022.03.21. 10:30 | 16 |
| 2022.03.21. 10:45 | 16 |
| 2022.03.21. 11:00 | 16 |
| 2022.03.21. 11:15 | 16 |
| 2022.03.21. 11:30 | 16 |
| 2022.03.21. 11:45 | 16 |
| 2022.03.21. 12:00 | 16 |
| 2022.03.21. 12:15 | 16 |
| 2022.03.21. 12:30 | 16 |
| 2022.03.21. 12:45 | 16 |
| 2022.03.21. 13:00 | 16 |
| 2022.03.21. 13:15 | 16 |
| 2022.03.21. 13:30 | 16 |
| 2022.03.21. 13:45 | 16 |
| 2022.03.21. 14:00 | 16 |
| 2022.03.21. 14:15 | 16 |
| 2022.03.21. 14:30 | 16 |
| 2022.03.21. 14:45 | 16 |
| 2022.03.21. 15:00 | 16 |
| 2022.03.21. 15:15 | 16 |
| 2022.03.21. 15:30 | 16 |
| 2022.03.21. 15:45 | 16 |
| 2022.03.21. 16:00 | 16 |
| 2022.03.21. 16:15 | 16 |
| 2022.03.21. 16:30 | 16 |
| 2022.03.21. 16:45 | 16 |
| 2022.03.21. 17:00 | 16 |
| 2022.03.21. 17:15 | 16 |
| 2022.03.21. 17:30 | 16 |
| 2022.03.21. 17:45 | 16 |
| 2022.03.21. 18:00 | 16 |
| 2022.03.21. 18:15 | 16 |
| 2022.03.21. 18:30 | 16 |
| 2022.03.21. 18:45 | 16 |
| 2022.03.21. 19:00 | 16 |
| 2022.03.21. 19:15 | 16 |
| 2022.03.21. 19:30 | 16 |
| 2022.03.21. 19:45 | 16 |
| 2022.03.21. 20:00 | 16 |
| 2022.03.21. 20:15 | 16 |
| 2022.03.21. 20:30 | 16 |
| 2022.03.21. 20:45 | 16 |
| 2022.03.21. 21:00 | 16 |
| 2022.03.21. 21:15 | 16 |
| 2022.03.21. 21:30 | 16 |
| 2022.03.21. 21:45 | 16 |
| 2022.03.21. 22:00 | 16 |
| 2022.03.21. 22:15 | 16 |
| 2022.03.21. 22:30 | 16 |
| 2022.03.21. 22:45 | 16 |
| 2022.03.21. 23:00 | 16 |
| 2022.03.21. 23:15 | 16 |
| 2022.03.21. 23:30 | 16 |
| 2022.03.21. 23:45 | 16 |
| 2022.03.22. 00:00 | 16 |
| 2022.03.22. 00:15 | 16 |
| 2022.03.22. 00:30 | 16 |
| 2022.03.22. 00:45 | 16 |
| 2022.03.22. 01:00 | 16 |
| 2022.03.22. 01:15 | 16 |
| 2022.03.22. 01:30 | 16 |
| 2022.03.22. 01:45 | 16 |
| 2022.03.22. 02:00 | 16 |
| 2022.03.22. 02:15 | 16 |
| 2022.03.22. 02:30 | 16 |
| 2022.03.22. 02:45 | 16 |
| 2022.03.22. 03:00 | 16 |
| 2022.03.22. 03:15 | 16 |
| 2022.03.22. 03:30 | 16 |
| 2022.03.22. 03:45 | 16 |
| 2022.03.22. 04:00 | 16 |
| 2022.03.22. 04:15 | 16 |
| 2022.03.22. 04:30 | 16 |
| 2022.03.22. 04:45 | 16 |
| 2022.03.22. 05:00 | 16 |
| 2022.03.22. 05:15 | 16 |
| 2022.03.22. 05:30 | 16 |
| 2022.03.22. 05:45 | 16 |
| 2022.03.22. 06:00 | 16 |
| 2022.03.22. 06:15 | 16 |
| 2022.03.22. 06:30 | 16 |
| 2022.03.22. 06:45 | 16 |
| 2022.03.22. 07:00 | 16 |
| 2022.03.22. 07:15 | 16 |
| 2022.03.22. 07:30 | 16 |
| 2022.03.22. 07:45 | 16 |
| 2022.03.22. 08:00 | 16 |
| 2022.03.22. 08:15 | 16 |
| 2022.03.22. 08:30 | 16 |
| 2022.03.22. 08:45 | 16 |
| 2022.03.22. 09:00 | 16 |
| 2022.03.22. 09:15 | 16 |
| 2022.03.22. 09:30 | 16 |
| 2022.03.22. 09:45 | 16 |
| 2022.03.22. 10:00 | 16 |
| 2022.03.22. 10:15 | 16 |
| 2022.03.22. 10:30 | 16 |
| 2022.03.22. 10:45 | 16 |
| 2022.03.22. 11:00 | 16 |
| 2022.03.22. 11:15 | 16 |
| 2022.03.22. 11:30 | 16 |
| 2022.03.22. 11:45 | 16 |
| 2022.03.22. 12:00 | 16 |
| 2022.03.22. 12:15 | 16 |
| 2022.03.22. 12:30 | 16 |
| 2022.03.22. 12:45 | 16 |
| 2022.03.22. 13:00 | 16 |
| 2022.03.22. 13:15 | 16 |
| 2022.03.22. 13:30 | 16 |
| 2022.03.22. 13:45 | 16 |
| 2022.03.22. 14:00 | 16 |
| 2022.03.22. 14:15 | 16 |
| 2022.03.22. 14:30 | 16 |
| 2022.03.22. 14:45 | 16 |
| 2022.03.22. 15:00 | 16 |
| 2022.03.22. 15:15 | 16 |
| 2022.03.22. 15:30 | 16 |
| 2022.03.22. 15:45 | 16 |
| 2022.03.22. 16:00 | 16 |
| 2022.03.22. 16:15 | 16 |
| 2022.03.22. 16:30 | 16 |
| 2022.03.22. 16:45 | 16 |
| 2022.03.22. 17:00 | 16 |
| 2022.03.22. 17:15 | 16 |
| 2022.03.22. 17:30 | 16 |
| 2022.03.22. 17:45 | 16 |
| 2022.03.22. 18:00 | 16 |
| 2022.03.22. 18:15 | 16 |
| 2022.03.22. 18:30 | 16 |
| 2022.03.22. 18:45 | 16 |
| 2022.03.22. 19:00 | 16 |
| 2022.03.22. 19:15 | 16 |
| 2022.03.22. 19:30 | 16 |
| 2022.03.22. 19:45 | 16 |
| 2022.03.22. 20:00 | 16 |
| 2022.03.22. 20:15 | 16 |
| 2022.03.22. 20:30 | 16 |
| 2022.03.22. 20:45 | 16 |
| 2022.03.22. 21:00 | 16 |
| 2022.03.22. 21:15 | 16 |
| 2022.03.22. 21:30 | 16 |
| 2022.03.22. 21:45 | 16 |
| 2022.03.22. 22:00 | 16 |
| 2022.03.22. 22:15 | 16 |
| 2022.03.22. 22:30 | 16 |
| 2022.03.22. 22:45 | 16 |
| 2022.03.22. 23:00 | 16 |
| 2022.03.22. 23:15 | 16 |
| 2022.03.22. 23:30 | 16 |
| 2022.03.22. 23:45 | 16 |
| 2022.03.23. 00:00 | 16 |
| 2022.03.23. 00:15 | 16 |
| 2022.03.23. 00:30 | 16 |
| 2022.03.23. 00:45 | 16 |
| 2022.03.23. 01:00 | 16 |
| 2022.03.23. 01:15 | 16 |
| 2022.03.23. 01:30 | 16 |
| 2022.03.23. 01:45 | 16 |
| 2022.03.23. 02:00 | 16 |
| 2022.03.23. 02:15 | 16 |
| 2022.03.23. 02:30 | 16 |
| 2022.03.23. 02:45 | 16 |
| 2022.03.23. 03:00 | 16 |
| 2022.03.23. 03:15 | 16 |
| 2022.03.23. 03:30 | 16 |
| 2022.03.23. 03:45 | 16 |
| 2022.03.23. 04:00 | 16 |
| 2022.03.23. 04:15 | 16 |
| 2022.03.23. 04:30 | 16 |
| 2022.03.23. 04:45 | 16 |
| 2022.03.23. 05:00 | 16 |
| 2022.03.23. 05:15 | 16 |
| 2022.03.23. 05:30 | 16 |
| 2022.03.23. 05:45 | 16 |
| 2022.03.23. 06:00 | 16 |
| 2022.03.23. 06:15 | 16 |
| 2022.03.23. 06:30 | 16 |
| 2022.03.23. 06:45 | 16 |
| 2022.03.23. 07:00 | 16 |
| 2022.03.23. 07:15 | 16 |
| 2022.03.23. 07:30 | 16 |
| 2022.03.23. 07:45 | 16 |
| 2022.03.23. 08:00 | 16 |
| 2022.03.23. 08:15 | 16 |
| 2022.03.23. 08:30 | 16 |
| 2022.03.23. 08:45 | 16 |
| 2022.03.23. 09:00 | 16 |
| 2022.03.23. 09:15 | 16 |
| 2022.03.23. 09:30 | 16 |
| 2022.03.23. 09:45 | 16 |
| 2022.03.23. 10:00 | 16 |
| 2022.03.23. 10:15 | 16 |
| 2022.03.23. 10:30 | 16 |
| 2022.03.23. 10:45 | 16 |
| 2022.03.23. 11:00 | 16 |
| 2022.03.23. 11:15 | 16 |
| 2022.03.23. 11:30 | 16 |
| 2022.03.23. 11:45 | 16 |
| 2022.03.23. 12:00 | 16 |
| 2022.03.23. 12:15 | 16 |
| 2022.03.23. 12:30 | 16 |
| 2022.03.23. 12:45 | 16 |
| 2022.03.23. 13:00 | 16 |
| 2022.03.23. 13:15 | 16 |
| 2022.03.23. 13:30 | 16 |
| 2022.03.23. 13:45 | 16 |
| 2022.03.23. 14:00 | 16 |
| 2022.03.23. 14:15 | 16 |
| 2022.03.23. 14:30 | 16 |
| 2022.03.23. 14:45 | 16 |
| 2022.03.23. 15:00 | 16 |
| 2022.03.23. 15:15 | 16 |
| 2022.03.23. 15:30 | 16 |
| 2022.03.23. 15:45 | 16 |
| 2022.03.23. 16:00 | 16 |
| 2022.03.23. 16:15 | 16 |
| 2022.03.23. 16:30 | 16 |
| 2022.03.23. 16:45 | 16 |
| 2022.03.23. 17:00 | 16 |
| 2022.03.23. 17:15 | 16 |
| 2022.03.23. 17:30 | 16 |
| 2022.03.23. 17:45 | 16 |
| 2022.03.23. 18:00 | 16 |
| 2022.03.23. 18:15 | 16 |
| 2022.03.23. 18:30 | 16 |
| 2022.03.23. 18:45 | 16 |
| 2022.03.23. 19:00 | 16 |
| 2022.03.23. 19:15 | 16 |
| 2022.03.23. 19:30 | 16 |
| 2022.03.23. 19:45 | 16 |
| 2022.03.23. 20:00 | 16 |
| 2022.03.23. 20:15 | 16 |
| 2022.03.23. 20:30 | 16 |
| 2022.03.23. 20:45 | 16 |
| 2022.03.23. 21:00 | 16 |
| 2022.03.23. 21:15 | 16 |
| 2022.03.23. 21:30 | 16 |
| 2022.03.23. 21:45 | 16 |
| 2022.03.23. 22:00 | 16 |
| 2022.03.23. 22:15 | 16 |
| 2022.03.23. 22:30 | 16 |
| 2022.03.23. 22:45 | 16 |
| 2022.03.23. 23:00 | 16 |
| 2022.03.23. 23:15 | 16 |
| 2022.03.23. 23:30 | 16 |
| 2022.03.23. 23:45 | 16 |
| 2022.03.24. 00:00 | 16 |
| 2022.03.24. 00:15 | 16 |
| 2022.03.24. 00:30 | 16 |
| 2022.03.24. 00:45 | 16 |
| 2022.03.24. 01:00 | 16 |
| 2022.03.24. 01:15 | 16 |
| 2022.03.24. 01:30 | 16 |
| 2022.03.24. 01:45 | 16 |
| 2022.03.24. 02:00 | 16 |
| 2022.03.24. 02:15 | 16 |
| 2022.03.24. 02:30 | 16 |
| 2022.03.24. 02:45 | 16 |
| 2022.03.24. 03:00 | 16 |
| 2022.03.24. 03:15 | 16 |
| 2022.03.24. 03:30 | 16 |
| 2022.03.24. 03:45 | 16 |
| 2022.03.24. 04:00 | 16 |
| 2022.03.24. 04:15 | 16 |
| 2022.03.24. 04:30 | 16 |
| 2022.03.24. 04:45 | 16 |
| 2022.03.24. 05:00 | 16 |
| 2022.03.24. 05:15 | 16 |
| 2022.03.24. 05:30 | 16 |
| 2022.03.24. 05:45 | 16 |
| 2022.03.24. 06:00 | 16 |
| 2022.03.24. 06:15 | 16 |
| 2022.03.24. 06:30 | 16 |
| 2022.03.24. 06:45 | 16 |
| 2022.03.24. 07:00 | 16 |
| 2022.03.24. 07:15 | 16 |
| 2022.03.24. 07:30 | 16 |
| 2022.03.24. 07:45 | 16 |
| 2022.03.24. 08:00 | 16 |
| 2022.03.24. 08:15 | 16 |
| 2022.03.24. 08:30 | 16 |
| 2022.03.24. 08:45 | 16 |
| 2022.03.24. 09:00 | 16 |
| 2022.03.24. 09:15 | 16 |
| 2022.03.24. 09:30 | 16 |
| 2022.03.24. 09:45 | 16 |
| 2022.03.24. 10:00 | 16 |
| 2022.03.24. 10:15 | 16 |
| 2022.03.24. 10:30 | 16 |
| 2022.03.24. 10:45 | 16 |
| 2022.03.24. 11:00 | 16 |
| 2022.03.24. 11:15 | 16 |
| 2022.03.24. 11:30 | 16 |
| 2022.03.24. 11:45 | 16 |
| 2022.03.24. 12:00 | 16 |
| 2022.03.24. 12:15 | 16 |
| 2022.03.24. 12:30 | 16 |
| 2022.03.24. 12:45 | 16 |
| 2022.03.24. 13:00 | 16 |
| 2022.03.24. 13:15 | 16 |
| 2022.03.24. 13:30 | 16 |
| 2022.03.24. 13:45 | 16 |
| 2022.03.24. 14:00 | 16 |
| 2022.03.24. 14:15 | 16 |
| 2022.03.24. 14:30 | 16 |
| 2022.03.24. 14:45 | 16 |
| 2022.03.24. 15:00 | 16 |
| 2022.03.24. 15:15 | 16 |
| 2022.03.24. 15:30 | 16 |
| 2022.03.24. 15:45 | 16 |
| 2022.03.24. 16:00 | 16 |
| 2022.03.24. 16:15 | 16 |
| 2022.03.24. 16:30 | 16 |
| 2022.03.24. 16:45 | 16 |
| 2022.03.24. 17:00 | 16 |
| 2022.03.24. 17:15 | 16 |
| 2022.03.24. 17:30 | 16 |
| 2022.03.24. 17:45 | 16 |
| 2022.03.24. 18:00 | 16 |
| 2022.03.24. 18:15 | 16 |
| 2022.03.24. 18:30 | 16 |
| 2022.03.24. 18:45 | 16 |
| 2022.03.24. 19:00 | 16 |
| 2022.03.24. 19:15 | 16 |
| 2022.03.24. 19:30 | 16 |
| 2022.03.24. 19:45 | 16 |
| 2022.03.24. 20:00 | 16 |
| 2022.03.24. 20:15 | 16 |
| 2022.03.24. 20:30 | 16 |
| 2022.03.24. 20:45 | 16 |
| 2022.03.24. 21:00 | 16 |
| 2022.03.24. 21:15 | 16 |
| 2022.03.24. 21:30 | 16 |
| 2022.03.24. 21:45 | 16 |
| 2022.03.24. 22:00 | 16 |
| 2022.03.24. 22:15 | 16 |
| 2022.03.24. 22:30 | 16 |
| 2022.03.24. 22:45 | 16 |
| 2022.03.24. 23:00 | 16 |
| 2022.03.24. 23:15 | 16 |
| 2022.03.24. 23:30 | 16 |
| 2022.03.24. 23:45 | 16 |
| 2022.03.25. 00:00 | 16 |
| 2022.03.25. 00:15 | 16 |
| 2022.03.25. 00:30 | 16 |
| 2022.03.25. 00:45 | 16 |
| 2022.03.25. 01:00 | 16 |
| 2022.03.25. 01:15 | 16 |
| 2022.03.25. 01:30 | 16 |
| 2022.03.25. 01:45 | 16 |
| 2022.03.25. 02:00 | 16 |
| 2022.03.25. 02:15 | 16 |
| 2022.03.25. 02:30 | 16 |
| 2022.03.25. 02:45 | 16 |
| 2022.03.25. 03:00 | 16 |
| 2022.03.25. 03:15 | 16 |
| 2022.03.25. 03:30 | 16 |
| 2022.03.25. 03:45 | 16 |
| 2022.03.25. 04:00 | 16 |
| 2022.03.25. 04:15 | 16 |
| 2022.03.25. 04:30 | 16 |
| 2022.03.25. 04:45 | 16 |
| 2022.03.25. 05:00 | 16 |
| 2022.03.25. 05:15 | 16 |
| 2022.03.25. 05:30 | 16 |
| 2022.03.25. 05:45 | 16 |
| 2022.03.25. 06:00 | 16 |
| 2022.03.25. 06:15 | 16 |
| 2022.03.25. 06:30 | 16 |
| 2022.03.25. 06:45 | 16 |
| 2022.03.25. 07:00 | 16 |
| 2022.03.25. 07:15 | 16 |
| 2022.03.25. 07:30 | 16 |
| 2022.03.25. 07:45 | 16 |
| 2022.03.25. 08:00 | 16 |
| 2022.03.25. 08:15 | 16 |
| 2022.03.25. 08:30 | 16 |
| 2022.03.25. 08:45 | 16 |
| 2022.03.25. 09:00 | 16 |
| 2022.03.25. 09:15 | 16 |
| 2022.03.25. 09:30 | 16 |
| 2022.03.25. 09:45 | 16 |
| 2022.03.25. 10:00 | 16 |
| 2022.03.25. 10:15 | 16 |
| 2022.03.25. 10:30 | 16 |
| 2022.03.25. 10:45 | 16 |
| 2022.03.25. 11:00 | 16 |
| 2022.03.25. 11:15 | 16 |
| 2022.03.25. 11:30 | 16 |
| 2022.03.25. 11:45 | 16 |
| 2022.03.25. 12:00 | 16 |
| 2022.03.25. 12:15 | 16 |
| 2022.03.25. 12:30 | 16 |
| 2022.03.25. 12:45 | 16 |
| 2022.03.25. 13:00 | 16 |
| 2022.03.25. 13:15 | 16 |
| 2022.03.25. 13:30 | 16 |
| 2022.03.25. 13:45 | 16 |
| 2022.03.25. 14:00 | 16 |
| 2022.03.25. 14:15 | 16 |
| 2022.03.25. 14:30 | 16 |
| 2022.03.25. 14:45 | 16 |
| 2022.03.25. 15:00 | 16 |
| 2022.03.25. 15:15 | 16 |
| 2022.03.25. 15:30 | 16 |
| 2022.03.25. 15:45 | 16 |
| 2022.03.25. 16:00 | 16 |
| 2022.03.25. 16:15 | 16 |
| 2022.03.25. 16:30 | 16 |
| 2022.03.25. 16:45 | 16 |
| 2022.03.25. 17:00 | 16 |
| 2022.03.25. 17:15 | 16 |
| 2022.03.25. 17:30 | 16 |
| 2022.03.25. 17:45 | 16 |
| 2022.03.25. 18:00 | 16 |
| 2022.03.25. 18:15 | 16 |
| 2022.03.25. 18:30 | 16 |
| 2022.03.25. 18:45 | 16 |
| 2022.03.25. 19:00 | 16 |
| 2022.03.25. 19:15 | 16 |
| 2022.03.25. 19:30 | 16 |
| 2022.03.25. 19:45 | 16 |
| 2022.03.25. 20:00 | 16 |
| 2022.03.25. 20:15 | 16 |
| 2022.03.25. 20:30 | 16 |
| 2022.03.25. 20:45 | 16 |
| 2022.03.25. 21:00 | 16 |
| 2022.03.25. 21:15 | 16 |
| 2022.03.25. 21:30 | 16 |
| 2022.03.25. 21:45 | 16 |
| 2022.03.25. 22:00 | 16 |
| 2022.03.25. 22:15 | 16 |
| 2022.03.25. 22:30 | 16 |
| 2022.03.25. 22:45 | 16 |
| 2022.03.25. 23:00 | 16 |
| 2022.03.25. 23:15 | 16 |
| 2022.03.25. 23:30 | 16 |
| 2022.03.25. 23:45 | 16 |
| 2022.03.26. 00:00 | 9 |
| 2022.03.26. 00:15 | 9 |
| 2022.03.26. 00:30 | 9 |
| 2022.03.26. 00:45 | 9 |
| 2022.03.26. 01:00 | 9 |
| 2022.03.26. 01:15 | 9 |
| 2022.03.26. 01:30 | 9 |
| 2022.03.26. 01:45 | 9 |
| 2022.03.26. 02:00 | 9 |
| 2022.03.26. 02:15 | 9 |
| 2022.03.26. 02:30 | 9 |
| 2022.03.26. 02:45 | 9 |
| 2022.03.26. 03:00 | 9 |
| 2022.03.26. 03:15 | 9 |
| 2022.03.26. 03:30 | 9 |
| 2022.03.26. 03:45 | 9 |
| 2022.03.26. 04:00 | 9 |
| 2022.03.26. 04:15 | 9 |
| 2022.03.26. 04:30 | 9 |
| 2022.03.26. 04:45 | 9 |
| 2022.03.26. 05:00 | 9 |
| 2022.03.26. 05:15 | 9 |
| 2022.03.26. 05:30 | 9 |
| 2022.03.26. 05:45 | 9 |
| 2022.03.26. 06:00 | 9 |
| 2022.03.26. 06:15 | 9 |
| 2022.03.26. 06:30 | 9 |
| 2022.03.26. 06:45 | 9 |
| 2022.03.26. 07:00 | 9 |
| 2022.03.26. 07:15 | 9 |
| 2022.03.26. 07:30 | 9 |
| 2022.03.26. 07:45 | 9 |
| 2022.03.26. 08:00 | 9 |
| 2022.03.26. 08:15 | 9 |
| 2022.03.26. 08:30 | 9 |
| 2022.03.26. 08:45 | 9 |
| 2022.03.26. 09:00 | 9 |
| 2022.03.26. 09:15 | 9 |
| 2022.03.26. 09:30 | 9 |
| 2022.03.26. 09:45 | 9 |
| 2022.03.26. 10:00 | 9 |
| 2022.03.26. 10:15 | 9 |
| 2022.03.26. 10:30 | 9 |
| 2022.03.26. 10:45 | 9 |
| 2022.03.26. 11:00 | 9 |
| 2022.03.26. 11:15 | 9 |
| 2022.03.26. 11:30 | 9 |
| 2022.03.26. 11:45 | 9 |
| 2022.03.26. 12:00 | 9 |
| 2022.03.26. 12:15 | 9 |
| 2022.03.26. 12:30 | 9 |
| 2022.03.26. 12:45 | 9 |
| 2022.03.26. 13:00 | 9 |
| 2022.03.26. 13:15 | 9 |
| 2022.03.26. 13:30 | 9 |
| 2022.03.26. 13:45 | 9 |
| 2022.03.26. 14:00 | 9 |
| 2022.03.26. 14:15 | 9 |
| 2022.03.26. 14:30 | 9 |
| 2022.03.26. 14:45 | 9 |
| 2022.03.26. 15:00 | 9 |
| 2022.03.26. 15:15 | 9 |
| 2022.03.26. 15:30 | 9 |
| 2022.03.26. 15:45 | 9 |
| 2022.03.26. 16:00 | 9 |
| 2022.03.26. 16:15 | 9 |
| 2022.03.26. 16:30 | 9 |
| 2022.03.26. 16:45 | 9 |
| 2022.03.26. 17:00 | 9 |
| 2022.03.26. 17:15 | 9 |
| 2022.03.26. 17:30 | 9 |
| 2022.03.26. 17:45 | 9 |
| 2022.03.26. 18:00 | 9 |
| 2022.03.26. 18:15 | 9 |
| 2022.03.26. 18:30 | 9 |
| 2022.03.26. 18:45 | 9 |
| 2022.03.26. 19:00 | 9 |
| 2022.03.26. 19:15 | 9 |
| 2022.03.26. 19:30 | 9 |
| 2022.03.26. 19:45 | 9 |
| 2022.03.26. 20:00 | 9 |
| 2022.03.26. 20:15 | 9 |
| 2022.03.26. 20:30 | 9 |
| 2022.03.26. 20:45 | 9 |
| 2022.03.26. 21:00 | 9 |
| 2022.03.26. 21:15 | 9 |
| 2022.03.26. 21:30 | 9 |
| 2022.03.26. 21:45 | 9 |
| 2022.03.26. 22:00 | 9 |
| 2022.03.26. 22:15 | 9 |
| 2022.03.26. 22:30 | 9 |
| 2022.03.26. 22:45 | 9 |
| 2022.03.26. 23:00 | 9 |
| 2022.03.26. 23:15 | 9 |
| 2022.03.26. 23:30 | 9 |
| 2022.03.26. 23:45 | 9 |
| 2022.03.27. 00:00 | 9 |
| 2022.03.27. 00:15 | 9 |
| 2022.03.27. 00:30 | 9 |
| 2022.03.27. 00:45 | 9 |
| 2022.03.27. 01:00 | 9 |
| 2022.03.27. 01:15 | 9 |
| 2022.03.27. 01:30 | 9 |
| 2022.03.27. 01:45 | 9 |
| 2022.03.27. 02:00 | 9 |
| 2022.03.27. 02:15 | 9 |
| 2022.03.27. 02:30 | 9 |
| 2022.03.27. 02:45 | 9 |
| 2022.03.27. 03:00 | 9 |
| 2022.03.27. 03:15 | 9 |
| 2022.03.27. 03:30 | 9 |
| 2022.03.27. 03:45 | 9 |
| 2022.03.27. 04:00 | 9 |
| 2022.03.27. 04:15 | 9 |
| 2022.03.27. 04:30 | 9 |
| 2022.03.27. 04:45 | 9 |
| 2022.03.27. 05:00 | 9 |
| 2022.03.27. 05:15 | 9 |
| 2022.03.27. 05:30 | 9 |
| 2022.03.27. 05:45 | 9 |
| 2022.03.27. 06:00 | 9 |
| 2022.03.27. 06:15 | 9 |
| 2022.03.27. 06:30 | 9 |
| 2022.03.27. 06:45 | 9 |
| 2022.03.27. 07:00 | 9 |
| 2022.03.27. 07:15 | 9 |
| 2022.03.27. 07:30 | 9 |
| 2022.03.27. 07:45 | 9 |
| 2022.03.27. 08:00 | 9 |
| 2022.03.27. 08:15 | 9 |
| 2022.03.27. 08:30 | 9 |
| 2022.03.27. 08:45 | 9 |
| 2022.03.27. 09:00 | 9 |
| 2022.03.27. 09:15 | 9 |
| 2022.03.27. 09:30 | 9 |
| 2022.03.27. 09:45 | 9 |
| 2022.03.27. 10:00 | 9 |
| 2022.03.27. 10:15 | 9 |
| 2022.03.27. 10:30 | 9 |
| 2022.03.27. 10:45 | 9 |
| 2022.03.27. 11:00 | 9 |
| 2022.03.27. 11:15 | 9 |
| 2022.03.27. 11:30 | 9 |
| 2022.03.27. 11:45 | 9 |
| 2022.03.27. 12:00 | 9 |
| 2022.03.27. 12:15 | 9 |
| 2022.03.27. 12:30 | 9 |
| 2022.03.27. 12:45 | 9 |
| 2022.03.27. 13:00 | 9 |
| 2022.03.27. 13:15 | 9 |
| 2022.03.27. 13:30 | 9 |
| 2022.03.27. 13:45 | 9 |
| 2022.03.27. 14:00 | 9 |
| 2022.03.27. 14:15 | 9 |
| 2022.03.27. 14:30 | 9 |
| 2022.03.27. 14:45 | 9 |
| 2022.03.27. 15:00 | 9 |
| 2022.03.27. 15:15 | 9 |
| 2022.03.27. 15:30 | 9 |
| 2022.03.27. 15:45 | 9 |
| 2022.03.27. 16:00 | 9 |
| 2022.03.27. 16:15 | 9 |
| 2022.03.27. 16:30 | 9 |
| 2022.03.27. 16:45 | 9 |
| 2022.03.27. 17:00 | 9 |
| 2022.03.27. 17:15 | 9 |
| 2022.03.27. 17:30 | 9 |
| 2022.03.27. 17:45 | 9 |
| 2022.03.27. 18:00 | 9 |
| 2022.03.27. 18:15 | 9 |
| 2022.03.27. 18:30 | 9 |
| 2022.03.27. 18:45 | 9 |
| 2022.03.27. 19:00 | 9 |
| 2022.03.27. 19:15 | 9 |
| 2022.03.27. 19:30 | 9 |
| 2022.03.27. 19:45 | 9 |
| 2022.03.27. 20:00 | 9 |
| 2022.03.27. 20:15 | 9 |
| 2022.03.27. 20:30 | 9 |
| 2022.03.27. 20:45 | 9 |
| 2022.03.27. 21:00 | 9 |
| 2022.03.27. 21:15 | 9 |
| 2022.03.27. 21:30 | 9 |
| 2022.03.27. 21:45 | 9 |
| 2022.03.27. 22:00 | 9 |
| 2022.03.27. 22:15 | 9 |
| 2022.03.27. 22:30 | 9 |
| 2022.03.27. 22:45 | 9 |
| 2022.03.27. 23:00 | 9 |
| 2022.03.27. 23:15 | 9 |
| 2022.03.27. 23:30 | 9 |
| 2022.03.27. 23:45 | 9 |
| 2022.03.28. 00:00 | 9 |
| 2022.03.28. 00:15 | 9 |
| 2022.03.28. 00:30 | 9 |
| 2022.03.28. 00:45 | 9 |
| 2022.03.28. 01:00 | 9 |
| 2022.03.28. 01:15 | 9 |
| 2022.03.28. 01:30 | 9 |
| 2022.03.28. 01:45 | 9 |
| 2022.03.28. 02:00 | 9 |
| 2022.03.28. 02:15 | 9 |
| 2022.03.28. 02:30 | 9 |
| 2022.03.28. 02:45 | 9 |
| 2022.03.28. 03:00 | 9 |
| 2022.03.28. 03:15 | 9 |
| 2022.03.28. 03:30 | 9 |
| 2022.03.28. 03:45 | 9 |
| 2022.03.28. 04:00 | 9 |
| 2022.03.28. 04:15 | 9 |
| 2022.03.28. 04:30 | 9 |
| 2022.03.28. 04:45 | 9 |
| 2022.03.28. 05:00 | 9 |
| 2022.03.28. 05:15 | 9 |
| 2022.03.28. 05:30 | 9 |
| 2022.03.28. 05:45 | 9 |
| 2022.03.28. 06:00 | 9 |
| 2022.03.28. 06:15 | 9 |
| 2022.03.28. 06:30 | 9 |
| 2022.03.28. 06:45 | 9 |
| 2022.03.28. 07:00 | 9 |
| 2022.03.28. 07:15 | 9 |
| 2022.03.28. 07:30 | 9 |
| 2022.03.28. 07:45 | 9 |
| 2022.03.28. 08:00 | 9 |
| 2022.03.28. 08:15 | 9 |
| 2022.03.28. 08:30 | 9 |
| 2022.03.28. 08:45 | 9 |
| 2022.03.28. 09:00 | 9 |
| 2022.03.28. 09:15 | 9 |
| 2022.03.28. 09:30 | 9 |
| 2022.03.28. 09:45 | 9 |
| 2022.03.28. 10:00 | 9 |
| 2022.03.28. 10:15 | 9 |
| 2022.03.28. 10:30 | 9 |
| 2022.03.28. 10:45 | 9 |
| 2022.03.28. 11:00 | 9 |
| 2022.03.28. 11:15 | 9 |
| 2022.03.28. 11:30 | 9 |
| 2022.03.28. 11:45 | 9 |
| 2022.03.28. 12:00 | 9 |
| 2022.03.28. 12:15 | 9 |
| 2022.03.28. 12:30 | 9 |
| 2022.03.28. 12:45 | 9 |
| 2022.03.28. 13:00 | 9 |
| 2022.03.28. 13:15 | 9 |
| 2022.03.28. 13:30 | 9 |
| 2022.03.28. 13:45 | 9 |
| 2022.03.28. 14:00 | 9 |
| 2022.03.28. 14:15 | 9 |
| 2022.03.28. 14:30 | 9 |
| 2022.03.28. 14:45 | 9 |
| 2022.03.28. 15:00 | 9 |
| 2022.03.28. 15:15 | 9 |
| 2022.03.28. 15:30 | 9 |
| 2022.03.28. 15:45 | 9 |
| 2022.03.28. 16:00 | 9 |
| 2022.03.28. 16:15 | 9 |
| 2022.03.28. 16:30 | 9 |
| 2022.03.28. 16:45 | 9 |
| 2022.03.28. 17:00 | 9 |
| 2022.03.28. 17:15 | 9 |
| 2022.03.28. 17:30 | 9 |
| 2022.03.28. 17:45 | 9 |
| 2022.03.28. 18:00 | 9 |
| 2022.03.28. 18:15 | 9 |
| 2022.03.28. 18:30 | 9 |
| 2022.03.28. 18:45 | 9 |
| 2022.03.28. 19:00 | 9 |
| 2022.03.28. 19:15 | 9 |
| 2022.03.28. 19:30 | 9 |
| 2022.03.28. 19:45 | 9 |
| 2022.03.28. 20:00 | 9 |
| 2022.03.28. 20:15 | 9 |
| 2022.03.28. 20:30 | 9 |
| 2022.03.28. 20:45 | 9 |
| 2022.03.28. 21:00 | 9 |
| 2022.03.28. 21:15 | 9 |
| 2022.03.28. 21:30 | 9 |
| 2022.03.28. 21:45 | 9 |
| 2022.03.28. 22:00 | 9 |
| 2022.03.28. 22:15 | 9 |
| 2022.03.28. 22:30 | 9 |
| 2022.03.28. 22:45 | 9 |
| 2022.03.28. 23:00 | 9 |
| 2022.03.28. 23:15 | 9 |
| 2022.03.28. 23:30 | 9 |
| 2022.03.28. 23:45 | 9 |
| 2022.03.29. 00:00 | 9 |
| 2022.03.29. 00:15 | 9 |
| 2022.03.29. 00:30 | 9 |
| 2022.03.29. 00:45 | 9 |
| 2022.03.29. 01:00 | 9 |
| 2022.03.29. 01:15 | 9 |
| 2022.03.29. 01:30 | 9 |
| 2022.03.29. 01:45 | 9 |
| 2022.03.30. 02:00 | 9 |
| 2022.03.31. 02:15 | 9 |
| 2022.04.01. 02:30 | 9 |
| 2022.04.02. 02:45 | 9 |
| 2022.03.29. 03:00 | 9 |
| 2022.03.29. 03:15 | 9 |
| 2022.03.29. 03:30 | 9 |
| 2022.03.29. 03:45 | 9 |
| 2022.03.29. 04:00 | 9 |
| 2022.03.29. 04:15 | 9 |
| 2022.03.29. 04:30 | 9 |
| 2022.03.29. 04:45 | 9 |
| 2022.03.29. 05:00 | 9 |
| 2022.03.29. 05:15 | 9 |
| 2022.03.29. 05:30 | 9 |
| 2022.03.29. 05:45 | 9 |
| 2022.03.29. 06:00 | 9 |
| 2022.03.29. 06:15 | 9 |
| 2022.03.29. 06:30 | 9 |
| 2022.03.29. 06:45 | 9 |
| 2022.03.29. 07:00 | 9 |
| 2022.03.29. 07:15 | 9 |
| 2022.03.29. 07:30 | 9 |
| 2022.03.29. 07:45 | 9 |
| 2022.03.29. 08:00 | 9 |
| 2022.03.29. 08:15 | 9 |
| 2022.03.29. 08:30 | 9 |
| 2022.03.29. 08:45 | 9 |
| 2022.03.29. 09:00 | 9 |
| 2022.03.29. 09:15 | 9 |
| 2022.03.29. 09:30 | 9 |
| 2022.03.29. 09:45 | 9 |
| 2022.03.29. 10:00 | 9 |
| 2022.03.29. 10:15 | 9 |
| 2022.03.29. 10:30 | 9 |
| 2022.03.29. 10:45 | 9 |
| 2022.03.29. 11:00 | 9 |
| 2022.03.29. 11:15 | 9 |
| 2022.03.29. 11:30 | 9 |
| 2022.03.29. 11:45 | 9 |
| 2022.03.29. 12:00 | 9 |
| 2022.03.29. 12:15 | 9 |
| 2022.03.29. 12:30 | 9 |
| 2022.03.29. 12:45 | 9 |
| 2022.03.29. 13:00 | 9 |
| 2022.03.29. 13:15 | 9 |
| 2022.03.29. 13:30 | 9 |
| 2022.03.29. 13:45 | 9 |
| 2022.03.29. 14:00 | 9 |
| 2022.03.29. 14:15 | 9 |
| 2022.03.29. 14:30 | 9 |
| 2022.03.29. 14:45 | 9 |
| 2022.03.29. 15:00 | 9 |
| 2022.03.29. 15:15 | 9 |
| 2022.03.29. 15:30 | 9 |
| 2022.03.29. 15:45 | 9 |
| 2022.03.29. 16:00 | 9 |
| 2022.03.29. 16:15 | 9 |
| 2022.03.29. 16:30 | 9 |
| 2022.03.29. 16:45 | 9 |
| 2022.03.29. 17:00 | 9 |
| 2022.03.29. 17:15 | 9 |
| 2022.03.29. 17:30 | 9 |
| 2022.03.29. 17:45 | 9 |
| 2022.03.29. 18:00 | 9 |
| 2022.03.29. 18:15 | 9 |
| 2022.03.29. 18:30 | 9 |
| 2022.03.29. 18:45 | 9 |
| 2022.03.29. 19:00 | 9 |
| 2022.03.29. 19:15 | 9 |
| 2022.03.29. 19:30 | 9 |
| 2022.03.29. 19:45 | 9 |
| 2022.03.29. 20:00 | 9 |
| 2022.03.29. 20:15 | 9 |
| 2022.03.29. 20:30 | 9 |
| 2022.03.29. 20:45 | 9 |
| 2022.03.29. 21:00 | 9 |
| 2022.03.29. 21:15 | 9 |
| 2022.03.29. 21:30 | 9 |
| 2022.03.29. 21:45 | 9 |
| 2022.03.29. 22:00 | 9 |
| 2022.03.29. 22:15 | 9 |
| 2022.03.29. 22:30 | 9 |
| 2022.03.29. 22:45 | 9 |
| 2022.03.29. 23:00 | 9 |
| 2022.03.29. 23:15 | 9 |
| 2022.03.29. 23:30 | 9 |
| 2022.03.29. 23:45 | 9 |
| 2022.03.30. 00:00 | 9 |
| 2022.03.30. 00:15 | 9 |
| 2022.03.30. 00:30 | 9 |
| 2022.03.30. 00:45 | 9 |
| 2022.03.30. 01:00 | 9 |
| 2022.03.30. 01:15 | 9 |
| 2022.03.30. 01:30 | 9 |
| 2022.03.30. 01:45 | 9 |
| 2022.03.30. 02:00 | 9 |
| 2022.03.30. 02:15 | 9 |
| 2022.03.30. 02:30 | 9 |
| 2022.03.30. 02:45 | 9 |
| 2022.03.30. 03:00 | 9 |
| 2022.03.30. 03:15 | 9 |
| 2022.03.30. 03:30 | 9 |
| 2022.03.30. 03:45 | 9 |
| 2022.03.30. 04:00 | 9 |
| 2022.03.30. 04:15 | 9 |
| 2022.03.30. 04:30 | 9 |
| 2022.03.30. 04:45 | 9 |
| 2022.03.30. 05:00 | 9 |
| 2022.03.30. 05:15 | 9 |
| 2022.03.30. 05:30 | 9 |
| 2022.03.30. 05:45 | 9 |
| 2022.03.30. 06:00 | 9 |
| 2022.03.30. 06:15 | 9 |
| 2022.03.30. 06:30 | 9 |
| 2022.03.30. 06:45 | 9 |
| 2022.03.30. 07:00 | 9 |
| 2022.03.30. 07:15 | 9 |
| 2022.03.30. 07:30 | 9 |
| 2022.03.30. 07:45 | 9 |
| 2022.03.30. 08:00 | 9 |
| 2022.03.30. 08:15 | 9 |
| 2022.03.30. 08:30 | 9 |
| 2022.03.30. 08:45 | 9 |
| 2022.03.30. 09:00 | 9 |
| 2022.03.30. 09:15 | 9 |
| 2022.03.30. 09:30 | 9 |
| 2022.03.30. 09:45 | 9 |
| 2022.03.30. 10:00 | 9 |
| 2022.03.30. 10:15 | 9 |
| 2022.03.30. 10:30 | 9 |
| 2022.03.30. 10:45 | 9 |
| 2022.03.30. 11:00 | 9 |
| 2022.03.30. 11:15 | 9 |
| 2022.03.30. 11:30 | 9 |
| 2022.03.30. 11:45 | 9 |
| 2022.03.30. 12:00 | 9 |
| 2022.03.30. 12:15 | 9 |
| 2022.03.30. 12:30 | 9 |
| 2022.03.30. 12:45 | 9 |
| 2022.03.30. 13:00 | 9 |
| 2022.03.30. 13:15 | 9 |
| 2022.03.30. 13:30 | 9 |
| 2022.03.30. 13:45 | 9 |
| 2022.03.30. 14:00 | 9 |
| 2022.03.30. 14:15 | 9 |
| 2022.03.30. 14:30 | 9 |
| 2022.03.30. 14:45 | 9 |
| 2022.03.30. 15:00 | 9 |
| 2022.03.30. 15:15 | 9 |
| 2022.03.30. 15:30 | 9 |
| 2022.03.30. 15:45 | 9 |
| 2022.03.30. 16:00 | 9 |
| 2022.03.30. 16:15 | 9 |
| 2022.03.30. 16:30 | 9 |
| 2022.03.30. 16:45 | 9 |
| 2022.03.30. 17:00 | 9 |
| 2022.03.30. 17:15 | 9 |
| 2022.03.30. 17:30 | 9 |
| 2022.03.30. 17:45 | 9 |
| 2022.03.30. 18:00 | 9 |
| 2022.03.30. 18:15 | 9 |
| 2022.03.30. 18:30 | 9 |
| 2022.03.30. 18:45 | 9 |
| 2022.03.30. 19:00 | 9 |
| 2022.03.30. 19:15 | 9 |
| 2022.03.30. 19:30 | 9 |
| 2022.03.30. 19:45 | 9 |
| 2022.03.30. 20:00 | 9 |
| 2022.03.30. 20:15 | 9 |
| 2022.03.30. 20:30 | 9 |
| 2022.03.30. 20:45 | 9 |
| 2022.03.30. 21:00 | 9 |
| 2022.03.30. 21:15 | 9 |
| 2022.03.30. 21:30 | 9 |
| 2022.03.30. 21:45 | 9 |
| 2022.03.30. 22:00 | 9 |
| 2022.03.30. 22:15 | 9 |
| 2022.03.30. 22:30 | 9 |
| 2022.03.30. 22:45 | 9 |
| 2022.03.30. 23:00 | 9 |
| 2022.03.30. 23:15 | 9 |
| 2022.03.30. 23:30 | 9 |
| 2022.03.30. 23:45 | 9 |
| 2022.03.31. 00:00 | 9 |
| 2022.03.31. 00:15 | 9 |
| 2022.03.31. 00:30 | 9 |
| 2022.03.31. 00:45 | 9 |
| 2022.03.31. 01:00 | 9 |
| 2022.03.31. 01:15 | 9 |
| 2022.03.31. 01:30 | 9 |
| 2022.03.31. 01:45 | 9 |
| 2022.03.31. 02:00 | 9 |
| 2022.03.31. 02:15 | 9 |
| 2022.03.31. 02:30 | 9 |
| 2022.03.31. 02:45 | 9 |
| 2022.03.31. 03:00 | 9 |
| 2022.03.31. 03:15 | 9 |
| 2022.03.31. 03:30 | 9 |
| 2022.03.31. 03:45 | 9 |
| 2022.03.31. 04:00 | 9 |
| 2022.03.31. 04:15 | 9 |
| 2022.03.31. 04:30 | 9 |
| 2022.03.31. 04:45 | 9 |
| 2022.03.31. 05:00 | 9 |
| 2022.03.31. 05:15 | 9 |
| 2022.03.31. 05:30 | 9 |
| 2022.03.31. 05:45 | 9 |
| 2022.03.31. 06:00 | 9 |
| 2022.03.31. 06:15 | 9 |
| 2022.03.31. 06:30 | 9 |
| 2022.03.31. 06:45 | 9 |
| 2022.03.31. 07:00 | 9 |
| 2022.03.31. 07:15 | 9 |
| 2022.03.31. 07:30 | 9 |
| 2022.03.31. 07:45 | 9 |
| 2022.03.31. 08:00 | 9 |
| 2022.03.31. 08:15 | 9 |
| 2022.03.31. 08:30 | 9 |
| 2022.03.31. 08:45 | 9 |
| 2022.03.31. 09:00 | 9 |
| 2022.03.31. 09:15 | 9 |
| 2022.03.31. 09:30 | 9 |
| 2022.03.31. 09:45 | 9 |
| 2022.03.31. 10:00 | 9 |
| 2022.03.31. 10:15 | 9 |
| 2022.03.31. 10:30 | 9 |
| 2022.03.31. 10:45 | 9 |
| 2022.03.31. 11:00 | 9 |
| 2022.03.31. 11:15 | 9 |
| 2022.03.31. 11:30 | 9 |
| 2022.03.31. 11:45 | 9 |
| 2022.03.31. 12:00 | 9 |
| 2022.03.31. 12:15 | 9 |
| 2022.03.31. 12:30 | 9 |
| 2022.03.31. 12:45 | 9 |
| 2022.03.31. 13:00 | 9 |
| 2022.03.31. 13:15 | 9 |
| 2022.03.31. 13:30 | 9 |
| 2022.03.31. 13:45 | 9 |
| 2022.03.31. 14:00 | 9 |
| 2022.03.31. 14:15 | 9 |
| 2022.03.31. 14:30 | 9 |
| 2022.03.31. 14:45 | 9 |
| 2022.03.31. 15:00 | 9 |
| 2022.03.31. 15:15 | 9 |
| 2022.03.31. 15:30 | 9 |
| 2022.03.31. 15:45 | 9 |
| 2022.03.31. 16:00 | 9 |
| 2022.03.31. 16:15 | 9 |
| 2022.03.31. 16:30 | 9 |
| 2022.03.31. 16:45 | 9 |
| 2022.03.31. 17:00 | 9 |
| 2022.03.31. 17:15 | 9 |
| 2022.03.31. 17:30 | 9 |
| 2022.03.31. 17:45 | 9 |
| 2022.03.31. 18:00 | 9 |
| 2022.03.31. 18:15 | 9 |
| 2022.03.31. 18:30 | 9 |
| 2022.03.31. 18:45 | 9 |
| 2022.03.31. 19:00 | 9 |
| 2022.03.31. 19:15 | 9 |
| 2022.03.31. 19:30 | 9 |
| 2022.03.31. 19:45 | 9 |
| 2022.03.31. 20:00 | 9 |
| 2022.03.31. 20:15 | 9 |
| 2022.03.31. 20:30 | 9 |
| 2022.03.31. 20:45 | 9 |
| 2022.03.31. 21:00 | 9 |
| 2022.03.31. 21:15 | 9 |
| 2022.03.31. 21:30 | 9 |
| 2022.03.31. 21:45 | 9 |
| 2022.03.31. 22:00 | 9 |
| 2022.03.31. 22:15 | 9 |
| 2022.03.31. 22:30 | 9 |
| 2022.03.31. 22:45 | 9 |
| 2022.03.31. 23:00 | 9 |
| 2022.03.31. 23:15 | 9 |
| 2022.03.31. 23:30 | 9 |
| 2022.03.31. 23:45 | 9 |
| 2022.04.01. 00:00 | 13 |
| 2022.04.01. 00:15 | 13 |
| 2022.04.01. 00:30 | 13 |
| 2022.04.01. 00:45 | 13 |
| 2022.04.01. 01:00 | 13 |
| 2022.04.01. 01:15 | 13 |
| 2022.04.01. 01:30 | 13 |
| 2022.04.01. 01:45 | 13 |
| 2022.04.01. 02:00 | 13 |
| 2022.04.01. 02:15 | 13 |
| 2022.04.01. 02:30 | 13 |
| 2022.04.01. 02:45 | 13 |
| 2022.04.01. 03:00 | 13 |
| 2022.04.01. 03:15 | 13 |
| 2022.04.01. 03:30 | 13 |
| 2022.04.01. 03:45 | 13 |
| 2022.04.01. 04:00 | 13 |
| 2022.04.01. 04:15 | 13 |
| 2022.04.01. 04:30 | 13 |
| 2022.04.01. 04:45 | 13 |
| 2022.04.01. 05:00 | 13 |
| 2022.04.01. 05:15 | 13 |
| 2022.04.01. 05:30 | 13 |
| 2022.04.01. 05:45 | 13 |
| 2022.04.01. 06:00 | 13 |
| 2022.04.01. 06:15 | 13 |
| 2022.04.01. 06:30 | 13 |
| 2022.04.01. 06:45 | 13 |
| 2022.04.01. 07:00 | 13 |
| 2022.04.01. 07:15 | 13 |
| 2022.04.01. 07:30 | 13 |
| 2022.04.01. 07:45 | 13 |
| 2022.04.01. 08:00 | 13 |
| 2022.04.01. 08:15 | 13 |
| 2022.04.01. 08:30 | 13 |
| 2022.04.01. 08:45 | 13 |
| 2022.04.01. 09:00 | 13 |
| 2022.04.01. 09:15 | 13 |
| 2022.04.01. 09:30 | 13 |
| 2022.04.01. 09:45 | 13 |
| 2022.04.01. 10:00 | 13 |
| 2022.04.01. 10:15 | 13 |
| 2022.04.01. 10:30 | 13 |
| 2022.04.01. 10:45 | 13 |
| 2022.04.01. 11:00 | 13 |
| 2022.04.01. 11:15 | 13 |
| 2022.04.01. 11:30 | 13 |
| 2022.04.01. 11:45 | 13 |
| 2022.04.01. 12:00 | 13 |
| 2022.04.01. 12:15 | 13 |
| 2022.04.01. 12:30 | 13 |
| 2022.04.01. 12:45 | 13 |
| 2022.04.01. 13:00 | 13 |
| 2022.04.01. 13:15 | 13 |
| 2022.04.01. 13:30 | 13 |
| 2022.04.01. 13:45 | 13 |
| 2022.04.01. 14:00 | 13 |
| 2022.04.01. 14:15 | 13 |
| 2022.04.01. 14:30 | 13 |
| 2022.04.01. 14:45 | 13 |
| 2022.04.01. 15:00 | 13 |
| 2022.04.01. 15:15 | 13 |
| 2022.04.01. 15:30 | 13 |
| 2022.04.01. 15:45 | 13 |
| 2022.04.01. 16:00 | 13 |
| 2022.04.01. 16:15 | 13 |
| 2022.04.01. 16:30 | 13 |
| 2022.04.01. 16:45 | 13 |
| 2022.04.01. 17:00 | 13 |
| 2022.04.01. 17:15 | 13 |
| 2022.04.01. 17:30 | 13 |
| 2022.04.01. 17:45 | 13 |
| 2022.04.01. 18:00 | 13 |
| 2022.04.01. 18:15 | 13 |
| 2022.04.01. 18:30 | 13 |
| 2022.04.01. 18:45 | 13 |
| 2022.04.01. 19:00 | 13 |
| 2022.04.01. 19:15 | 13 |
| 2022.04.01. 19:30 | 13 |
| 2022.04.01. 19:45 | 13 |
| 2022.04.01. 20:00 | 13 |
| 2022.04.01. 20:15 | 13 |
| 2022.04.01. 20:30 | 13 |
| 2022.04.01. 20:45 | 13 |
| 2022.04.01. 21:00 | 13 |
| 2022.04.01. 21:15 | 13 |
| 2022.04.01. 21:30 | 13 |
| 2022.04.01. 21:45 | 13 |
| 2022.04.01. 22:00 | 13 |
| 2022.04.01. 22:15 | 13 |
| 2022.04.01. 22:30 | 13 |
| 2022.04.01. 22:45 | 13 |
| 2022.04.01. 23:00 | 13 |
| 2022.04.01. 23:15 | 13 |
| 2022.04.01. 23:30 | 13 |
| 2022.04.01. 23:45 | 13 |
| 2022.04.02. 00:00 | 13 |
| 2022.04.02. 00:15 | 13 |
| 2022.04.02. 00:30 | 13 |
| 2022.04.02. 00:45 | 13 |
| 2022.04.02. 01:00 | 13 |
| 2022.04.02. 01:15 | 13 |
| 2022.04.02. 01:30 | 13 |
| 2022.04.02. 01:45 | 13 |
| 2022.04.02. 02:00 | 13 |
| 2022.04.02. 02:15 | 13 |
| 2022.04.02. 02:30 | 13 |
| 2022.04.02. 02:45 | 13 |
| 2022.04.02. 03:00 | 13 |
| 2022.04.02. 03:15 | 13 |
| 2022.04.02. 03:30 | 13 |
| 2022.04.02. 03:45 | 13 |
| 2022.04.02. 04:00 | 13 |
| 2022.04.02. 04:15 | 13 |
| 2022.04.02. 04:30 | 13 |
| 2022.04.02. 04:45 | 13 |
| 2022.04.02. 05:00 | 13 |
| 2022.04.02. 05:15 | 13 |
| 2022.04.02. 05:30 | 13 |
| 2022.04.02. 05:45 | 13 |
| 2022.04.02. 06:00 | 13 |
| 2022.04.02. 06:15 | 13 |
| 2022.04.02. 06:30 | 13 |
| 2022.04.02. 06:45 | 13 |
| 2022.04.02. 07:00 | 13 |
| 2022.04.02. 07:15 | 13 |
| 2022.04.02. 07:30 | 13 |
| 2022.04.02. 07:45 | 13 |
| 2022.04.02. 08:00 | 13 |
| 2022.04.02. 08:15 | 13 |
| 2022.04.02. 08:30 | 13 |
| 2022.04.02. 08:45 | 13 |
| 2022.04.02. 09:00 | 13 |
| 2022.04.02. 09:15 | 13 |
| 2022.04.02. 09:30 | 13 |
| 2022.04.02. 09:45 | 13 |
| 2022.04.02. 10:00 | 13 |
| 2022.04.02. 10:15 | 13 |
| 2022.04.02. 10:30 | 13 |
| 2022.04.02. 10:45 | 13 |
| 2022.04.02. 11:00 | 13 |
| 2022.04.02. 11:15 | 13 |
| 2022.04.02. 11:30 | 13 |
| 2022.04.02. 11:45 | 13 |
| 2022.04.02. 12:00 | 13 |
| 2022.04.02. 12:15 | 13 |
| 2022.04.02. 12:30 | 13 |
| 2022.04.02. 12:45 | 13 |
| 2022.04.02. 13:00 | 13 |
| 2022.04.02. 13:15 | 13 |
| 2022.04.02. 13:30 | 13 |
| 2022.04.02. 13:45 | 13 |
| 2022.04.02. 14:00 | 13 |
| 2022.04.02. 14:15 | 13 |
| 2022.04.02. 14:30 | 13 |
| 2022.04.02. 14:45 | 13 |
| 2022.04.02. 15:00 | 13 |
| 2022.04.02. 15:15 | 13 |
| 2022.04.02. 15:30 | 13 |
| 2022.04.02. 15:45 | 13 |
| 2022.04.02. 16:00 | 13 |
| 2022.04.02. 16:15 | 13 |
| 2022.04.02. 16:30 | 13 |
| 2022.04.02. 16:45 | 13 |
| 2022.04.02. 17:00 | 13 |
| 2022.04.02. 17:15 | 13 |
| 2022.04.02. 17:30 | 13 |
| 2022.04.02. 17:45 | 13 |
| 2022.04.02. 18:00 | 13 |
| 2022.04.02. 18:15 | 13 |
| 2022.04.02. 18:30 | 13 |
| 2022.04.02. 18:45 | 13 |
| 2022.04.02. 19:00 | 13 |
| 2022.04.02. 19:15 | 13 |
| 2022.04.02. 19:30 | 13 |
| 2022.04.02. 19:45 | 13 |
| 2022.04.02. 20:00 | 13 |
| 2022.04.02. 20:15 | 13 |
| 2022.04.02. 20:30 | 13 |
| 2022.04.02. 20:45 | 13 |
| 2022.04.02. 21:00 | 13 |
| 2022.04.02. 21:15 | 13 |
| 2022.04.02. 21:30 | 13 |
| 2022.04.02. 21:45 | 13 |
| 2022.04.02. 22:00 | 13 |
| 2022.04.02. 22:15 | 13 |
| 2022.04.02. 22:30 | 13 |
| 2022.04.02. 22:45 | 13 |
| 2022.04.02. 23:00 | 13 |
| 2022.04.02. 23:15 | 13 |
| 2022.04.02. 23:30 | 13 |
| 2022.04.02. 23:45 | 13 |
| 2022.04.03. 00:00 | 13 |
| 2022.04.03. 00:15 | 13 |
| 2022.04.03. 00:30 | 13 |
| 2022.04.03. 00:45 | 13 |
| 2022.04.03. 01:00 | 13 |
| 2022.04.03. 01:15 | 13 |
| 2022.04.03. 01:30 | 13 |
| 2022.04.03. 01:45 | 13 |
| 2022.04.03. 02:00 | 13 |
| 2022.04.03. 02:15 | 13 |
| 2022.04.03. 02:30 | 13 |
| 2022.04.03. 02:45 | 13 |
| 2022.04.03. 03:00 | 13 |
| 2022.04.03. 03:15 | 13 |
| 2022.04.03. 03:30 | 13 |
| 2022.04.03. 03:45 | 13 |
| 2022.04.03. 04:00 | 13 |
| 2022.04.03. 04:15 | 13 |
| 2022.04.03. 04:30 | 13 |
| 2022.04.03. 04:45 | 13 |
| 2022.04.03. 05:00 | 13 |
| 2022.04.03. 05:15 | 13 |
| 2022.04.03. 05:30 | 13 |
| 2022.04.03. 05:45 | 13 |
| 2022.04.03. 06:00 | 13 |
| 2022.04.03. 06:15 | 13 |
| 2022.04.03. 06:30 | 13 |
| 2022.04.03. 06:45 | 13 |
| 2022.04.03. 07:00 | 13 |
| 2022.04.03. 07:15 | 13 |
| 2022.04.03. 07:30 | 13 |
| 2022.04.03. 07:45 | 13 |
| 2022.04.03. 08:00 | 13 |
| 2022.04.03. 08:15 | 13 |
| 2022.04.03. 08:30 | 13 |
| 2022.04.03. 08:45 | 13 |
| 2022.04.03. 09:00 | 13 |
| 2022.04.03. 09:15 | 13 |
| 2022.04.03. 09:30 | 13 |
| 2022.04.03. 09:45 | 13 |
| 2022.04.03. 10:00 | 13 |
| 2022.04.03. 10:15 | 13 |
| 2022.04.03. 10:30 | 13 |
| 2022.04.03. 10:45 | 13 |
| 2022.04.03. 11:00 | 13 |
| 2022.04.03. 11:15 | 13 |
| 2022.04.03. 11:30 | 13 |
| 2022.04.03. 11:45 | 13 |
| 2022.04.03. 12:00 | 13 |
| 2022.04.03. 12:15 | 13 |
| 2022.04.03. 12:30 | 13 |
| 2022.04.03. 12:45 | 13 |
| 2022.04.03. 13:00 | 13 |
| 2022.04.03. 13:15 | 13 |
| 2022.04.03. 13:30 | 13 |
| 2022.04.03. 13:45 | 13 |
| 2022.04.03. 14:00 | 13 |
| 2022.04.03. 14:15 | 13 |
| 2022.04.03. 14:30 | 13 |
| 2022.04.03. 14:45 | 13 |
| 2022.04.03. 15:00 | 13 |
| 2022.04.03. 15:15 | 13 |
| 2022.04.03. 15:30 | 13 |
| 2022.04.03. 15:45 | 13 |
| 2022.04.03. 16:00 | 13 |
| 2022.04.03. 16:15 | 13 |
| 2022.04.03. 16:30 | 13 |
| 2022.04.03. 16:45 | 13 |
| 2022.04.03. 17:00 | 13 |
| 2022.04.03. 17:15 | 13 |
| 2022.04.03. 17:30 | 13 |
| 2022.04.03. 17:45 | 13 |
| 2022.04.03. 18:00 | 13 |
| 2022.04.03. 18:15 | 13 |
| 2022.04.03. 18:30 | 13 |
| 2022.04.03. 18:45 | 13 |
| 2022.04.03. 19:00 | 13 |
| 2022.04.03. 19:15 | 13 |
| 2022.04.03. 19:30 | 13 |
| 2022.04.03. 19:45 | 13 |
| 2022.04.03. 20:00 | 13 |
| 2022.04.03. 20:15 | 13 |
| 2022.04.03. 20:30 | 13 |
| 2022.04.03. 20:45 | 13 |
| 2022.04.03. 21:00 | 13 |
| 2022.04.03. 21:15 | 13 |
| 2022.04.03. 21:30 | 13 |
| 2022.04.03. 21:45 | 13 |
| 2022.04.03. 22:00 | 13 |
| 2022.04.03. 22:15 | 13 |
| 2022.04.03. 22:30 | 13 |
| 2022.04.03. 22:45 | 13 |
| 2022.04.03. 23:00 | 13 |
| 2022.04.03. 23:15 | 13 |
| 2022.04.03. 23:30 | 13 |
| 2022.04.03. 23:45 | 13 |
| 2022.04.04. 00:00 | 13 |
| 2022.04.04. 00:15 | 13 |
| 2022.04.04. 00:30 | 13 |
| 2022.04.04. 00:45 | 13 |
| 2022.04.04. 01:00 | 13 |
| 2022.04.04. 01:15 | 13 |
| 2022.04.04. 01:30 | 13 |
| 2022.04.04. 01:45 | 13 |
| 2022.04.04. 02:00 | 13 |
| 2022.04.04. 02:15 | 13 |
| 2022.04.04. 02:30 | 13 |
| 2022.04.04. 02:45 | 13 |
| 2022.04.04. 03:00 | 13 |
| 2022.04.04. 03:15 | 13 |
| 2022.04.04. 03:30 | 13 |
| 2022.04.04. 03:45 | 13 |
| 2022.04.04. 04:00 | 13 |
| 2022.04.04. 04:15 | 13 |
| 2022.04.04. 04:30 | 13 |
| 2022.04.04. 04:45 | 13 |
| 2022.04.04. 05:00 | 13 |
| 2022.04.04. 05:15 | 13 |
| 2022.04.04. 05:30 | 13 |
| 2022.04.04. 05:45 | 13 |
| 2022.04.04. 06:00 | 13 |
| 2022.04.04. 06:15 | 13 |
| 2022.04.04. 06:30 | 13 |
| 2022.04.04. 06:45 | 13 |
| 2022.04.04. 07:00 | 13 |
| 2022.04.04. 07:15 | 13 |
| 2022.04.04. 07:30 | 13 |
| 2022.04.04. 07:45 | 13 |
| 2022.04.04. 08:00 | 13 |
| 2022.04.04. 08:15 | 13 |
| 2022.04.04. 08:30 | 13 |
| 2022.04.04. 08:45 | 13 |
| 2022.04.04. 09:00 | 13 |
| 2022.04.04. 09:15 | 13 |
| 2022.04.04. 09:30 | 13 |
| 2022.04.04. 09:45 | 13 |
| 2022.04.04. 10:00 | 13 |
| 2022.04.04. 10:15 | 13 |
| 2022.04.04. 10:30 | 13 |
| 2022.04.04. 10:45 | 13 |
| 2022.04.04. 11:00 | 13 |
| 2022.04.04. 11:15 | 13 |
| 2022.04.04. 11:30 | 13 |
| 2022.04.04. 11:45 | 13 |
| 2022.04.04. 12:00 | 13 |
| 2022.04.04. 12:15 | 13 |
| 2022.04.04. 12:30 | 13 |
| 2022.04.04. 12:45 | 13 |
| 2022.04.04. 13:00 | 13 |
| 2022.04.04. 13:15 | 13 |
| 2022.04.04. 13:30 | 13 |
| 2022.04.04. 13:45 | 13 |
| 2022.04.04. 14:00 | 13 |
| 2022.04.04. 14:15 | 13 |
| 2022.04.04. 14:30 | 13 |
| 2022.04.04. 14:45 | 13 |
| 2022.04.04. 15:00 | 13 |
| 2022.04.04. 15:15 | 13 |
| 2022.04.04. 15:30 | 13 |
| 2022.04.04. 15:45 | 13 |
| 2022.04.04. 16:00 | 13 |
| 2022.04.04. 16:15 | 13 |
| 2022.04.04. 16:30 | 13 |
| 2022.04.04. 16:45 | 13 |
| 2022.04.04. 17:00 | 13 |
| 2022.04.04. 17:15 | 13 |
| 2022.04.04. 17:30 | 13 |
| 2022.04.04. 17:45 | 13 |
| 2022.04.04. 18:00 | 13 |
| 2022.04.04. 18:15 | 13 |
| 2022.04.04. 18:30 | 13 |
| 2022.04.04. 18:45 | 13 |
| 2022.04.04. 19:00 | 13 |
| 2022.04.04. 19:15 | 13 |
| 2022.04.04. 19:30 | 13 |
| 2022.04.04. 19:45 | 13 |
| 2022.04.04. 20:00 | 13 |
| 2022.04.04. 20:15 | 13 |
| 2022.04.04. 20:30 | 13 |
| 2022.04.04. 20:45 | 13 |
| 2022.04.04. 21:00 | 13 |
| 2022.04.04. 21:15 | 13 |
| 2022.04.04. 21:30 | 13 |
| 2022.04.04. 21:45 | 13 |
| 2022.04.04. 22:00 | 13 |
| 2022.04.04. 22:15 | 13 |
| 2022.04.04. 22:30 | 13 |
| 2022.04.04. 22:45 | 13 |
| 2022.04.04. 23:00 | 13 |
| 2022.04.04. 23:15 | 13 |
| 2022.04.04. 23:30 | 13 |
| 2022.04.04. 23:45 | 13 |
| 2022.04.05. 00:00 | 13 |
| 2022.04.05. 00:15 | 13 |
| 2022.04.05. 00:30 | 13 |
| 2022.04.05. 00:45 | 13 |
| 2022.04.05. 01:00 | 13 |
| 2022.04.05. 01:15 | 13 |
| 2022.04.05. 01:30 | 13 |
| 2022.04.05. 01:45 | 13 |
| 2022.04.05. 02:00 | 13 |
| 2022.04.05. 02:15 | 13 |
| 2022.04.05. 02:30 | 13 |
| 2022.04.05. 02:45 | 13 |
| 2022.04.05. 03:00 | 13 |
| 2022.04.05. 03:15 | 13 |
| 2022.04.05. 03:30 | 13 |
| 2022.04.05. 03:45 | 13 |
| 2022.04.05. 04:00 | 13 |
| 2022.04.05. 04:15 | 13 |
| 2022.04.05. 04:30 | 13 |
| 2022.04.05. 04:45 | 13 |
| 2022.04.05. 05:00 | 13 |
| 2022.04.05. 05:15 | 13 |
| 2022.04.05. 05:30 | 13 |
| 2022.04.05. 05:45 | 13 |
| 2022.04.05. 06:00 | 13 |
| 2022.04.05. 06:15 | 13 |
| 2022.04.05. 06:30 | 13 |
| 2022.04.05. 06:45 | 13 |
| 2022.04.05. 07:00 | 13 |
| 2022.04.05. 07:15 | 13 |
| 2022.04.05. 07:30 | 13 |
| 2022.04.05. 07:45 | 13 |
| 2022.04.05. 08:00 | 13 |
| 2022.04.05. 08:15 | 13 |
| 2022.04.05. 08:30 | 13 |
| 2022.04.05. 08:45 | 13 |
| 2022.04.05. 09:00 | 13 |
| 2022.04.05. 09:15 | 13 |
| 2022.04.05. 09:30 | 13 |
| 2022.04.05. 09:45 | 13 |
| 2022.04.05. 10:00 | 13 |
| 2022.04.05. 10:15 | 13 |
| 2022.04.05. 10:30 | 13 |
| 2022.04.05. 10:45 | 13 |
| 2022.04.05. 11:00 | 13 |
| 2022.04.05. 11:15 | 13 |
| 2022.04.05. 11:30 | 13 |
| 2022.04.05. 11:45 | 13 |
| 2022.04.05. 12:00 | 13 |
| 2022.04.05. 12:15 | 13 |
| 2022.04.05. 12:30 | 13 |
| 2022.04.05. 12:45 | 13 |
| 2022.04.05. 13:00 | 13 |
| 2022.04.05. 13:15 | 13 |
| 2022.04.05. 13:30 | 13 |
| 2022.04.05. 13:45 | 13 |
| 2022.04.05. 14:00 | 13 |
| 2022.04.05. 14:15 | 13 |
| 2022.04.05. 14:30 | 13 |
| 2022.04.05. 14:45 | 13 |
| 2022.04.05. 15:00 | 13 |
| 2022.04.05. 15:15 | 13 |
| 2022.04.05. 15:30 | 13 |
| 2022.04.05. 15:45 | 13 |
| 2022.04.05. 16:00 | 13 |
| 2022.04.05. 16:15 | 13 |
| 2022.04.05. 16:30 | 13 |
| 2022.04.05. 16:45 | 13 |
| 2022.04.05. 17:00 | 13 |
| 2022.04.05. 17:15 | 13 |
| 2022.04.05. 17:30 | 13 |
| 2022.04.05. 17:45 | 13 |
| 2022.04.05. 18:00 | 13 |
| 2022.04.05. 18:15 | 13 |
| 2022.04.05. 18:30 | 13 |
| 2022.04.05. 18:45 | 13 |
| 2022.04.05. 19:00 | 13 |
| 2022.04.05. 19:15 | 13 |
| 2022.04.05. 19:30 | 13 |
| 2022.04.05. 19:45 | 13 |
| 2022.04.05. 20:00 | 13 |
| 2022.04.05. 20:15 | 13 |
| 2022.04.05. 20:30 | 13 |
| 2022.04.05. 20:45 | 13 |
| 2022.04.05. 21:00 | 13 |
| 2022.04.05. 21:15 | 13 |
| 2022.04.05. 21:30 | 13 |
| 2022.04.05. 21:45 | 13 |
| 2022.04.05. 22:00 | 13 |
| 2022.04.05. 22:15 | 13 |
| 2022.04.05. 22:30 | 13 |
| 2022.04.05. 22:45 | 13 |
| 2022.04.05. 23:00 | 13 |
| 2022.04.05. 23:15 | 13 |
| 2022.04.05. 23:30 | 13 |
| 2022.04.05. 23:45 | 13 |
| 2022.04.06. 00:00 | 13 |
| 2022.04.06. 00:15 | 13 |
| 2022.04.06. 00:30 | 13 |
| 2022.04.06. 00:45 | 13 |
| 2022.04.06. 01:00 | 13 |
| 2022.04.06. 01:15 | 13 |
| 2022.04.06. 01:30 | 13 |
| 2022.04.06. 01:45 | 13 |
| 2022.04.06. 02:00 | 13 |
| 2022.04.06. 02:15 | 13 |
| 2022.04.06. 02:30 | 13 |
| 2022.04.06. 02:45 | 13 |
| 2022.04.06. 03:00 | 13 |
| 2022.04.06. 03:15 | 13 |
| 2022.04.06. 03:30 | 13 |
| 2022.04.06. 03:45 | 13 |
| 2022.04.06. 04:00 | 13 |
| 2022.04.06. 04:15 | 13 |
| 2022.04.06. 04:30 | 13 |
| 2022.04.06. 04:45 | 13 |
| 2022.04.06. 05:00 | 13 |
| 2022.04.06. 05:15 | 13 |
| 2022.04.06. 05:30 | 13 |
| 2022.04.06. 05:45 | 13 |
| 2022.04.06. 06:00 | 13 |
| 2022.04.06. 06:15 | 13 |
| 2022.04.06. 06:30 | 13 |
| 2022.04.06. 06:45 | 13 |
| 2022.04.06. 07:00 | 13 |
| 2022.04.06. 07:15 | 13 |
| 2022.04.06. 07:30 | 13 |
| 2022.04.06. 07:45 | 13 |
| 2022.04.06. 08:00 | 13 |
| 2022.04.06. 08:15 | 13 |
| 2022.04.06. 08:30 | 13 |
| 2022.04.06. 08:45 | 13 |
| 2022.04.06. 09:00 | 13 |
| 2022.04.06. 09:15 | 13 |
| 2022.04.06. 09:30 | 13 |
| 2022.04.06. 09:45 | 13 |
| 2022.04.06. 10:00 | 13 |
| 2022.04.06. 10:15 | 13 |
| 2022.04.06. 10:30 | 13 |
| 2022.04.06. 10:45 | 13 |
| 2022.04.06. 11:00 | 13 |
| 2022.04.06. 11:15 | 13 |
| 2022.04.06. 11:30 | 13 |
| 2022.04.06. 11:45 | 13 |
| 2022.04.06. 12:00 | 13 |
| 2022.04.06. 12:15 | 13 |
| 2022.04.06. 12:30 | 13 |
| 2022.04.06. 12:45 | 13 |
| 2022.04.06. 13:00 | 13 |
| 2022.04.06. 13:15 | 13 |
| 2022.04.06. 13:30 | 13 |
| 2022.04.06. 13:45 | 13 |
| 2022.04.06. 14:00 | 13 |
| 2022.04.06. 14:15 | 13 |
| 2022.04.06. 14:30 | 13 |
| 2022.04.06. 14:45 | 13 |
| 2022.04.06. 15:00 | 13 |
| 2022.04.06. 15:15 | 13 |
| 2022.04.06. 15:30 | 13 |
| 2022.04.06. 15:45 | 13 |
| 2022.04.06. 16:00 | 13 |
| 2022.04.06. 16:15 | 13 |
| 2022.04.06. 16:30 | 13 |
| 2022.04.06. 16:45 | 13 |
| 2022.04.06. 17:00 | 13 |
| 2022.04.06. 17:15 | 13 |
| 2022.04.06. 17:30 | 13 |
| 2022.04.06. 17:45 | 13 |
| 2022.04.06. 18:00 | 13 |
| 2022.04.06. 18:15 | 13 |
| 2022.04.06. 18:30 | 13 |
| 2022.04.06. 18:45 | 13 |
| 2022.04.06. 19:00 | 13 |
| 2022.04.06. 19:15 | 13 |
| 2022.04.06. 19:30 | 13 |
| 2022.04.06. 19:45 | 13 |
| 2022.04.06. 20:00 | 13 |
| 2022.04.06. 20:15 | 13 |
| 2022.04.06. 20:30 | 13 |
| 2022.04.06. 20:45 | 13 |
| 2022.04.06. 21:00 | 13 |
| 2022.04.06. 21:15 | 13 |
| 2022.04.06. 21:30 | 13 |
| 2022.04.06. 21:45 | 13 |
| 2022.04.06. 22:00 | 13 |
| 2022.04.06. 22:15 | 13 |
| 2022.04.06. 22:30 | 13 |
| 2022.04.06. 22:45 | 13 |
| 2022.04.06. 23:00 | 13 |
| 2022.04.06. 23:15 | 13 |
| 2022.04.06. 23:30 | 13 |
| 2022.04.06. 23:45 | 13 |
| 2022.04.07. 00:00 | 13 |
| 2022.04.07. 00:15 | 13 |
| 2022.04.07. 00:30 | 13 |
| 2022.04.07. 00:45 | 13 |
| 2022.04.07. 01:00 | 13 |
| 2022.04.07. 01:15 | 13 |
| 2022.04.07. 01:30 | 13 |
| 2022.04.07. 01:45 | 13 |
| 2022.04.07. 02:00 | 13 |
| 2022.04.07. 02:15 | 13 |
| 2022.04.07. 02:30 | 13 |
| 2022.04.07. 02:45 | 13 |
| 2022.04.07. 03:00 | 13 |
| 2022.04.07. 03:15 | 13 |
| 2022.04.07. 03:30 | 13 |
| 2022.04.07. 03:45 | 13 |
| 2022.04.07. 04:00 | 13 |
| 2022.04.07. 04:15 | 13 |
| 2022.04.07. 04:30 | 13 |
| 2022.04.07. 04:45 | 13 |
| 2022.04.07. 05:00 | 13 |
| 2022.04.07. 05:15 | 13 |
| 2022.04.07. 05:30 | 13 |
| 2022.04.07. 05:45 | 13 |
| 2022.04.07. 06:00 | 13 |
| 2022.04.07. 06:15 | 13 |
| 2022.04.07. 06:30 | 13 |
| 2022.04.07. 06:45 | 13 |
| 2022.04.07. 07:00 | 13 |
| 2022.04.07. 07:15 | 13 |
| 2022.04.07. 07:30 | 13 |
| 2022.04.07. 07:45 | 13 |
| 2022.04.07. 08:00 | 13 |
| 2022.04.07. 08:15 | 13 |
| 2022.04.07. 08:30 | 13 |
| 2022.04.07. 08:45 | 13 |
| 2022.04.07. 09:00 | 13 |
| 2022.04.07. 09:15 | 13 |
| 2022.04.07. 09:30 | 13 |
| 2022.04.07. 09:45 | 13 |
| 2022.04.07. 10:00 | 13 |
| 2022.04.07. 10:15 | 13 |
| 2022.04.07. 10:30 | 13 |
| 2022.04.07. 10:45 | 13 |
| 2022.04.07. 11:00 | 13 |
| 2022.04.07. 11:15 | 13 |
| 2022.04.07. 11:30 | 13 |
| 2022.04.07. 11:45 | 13 |
| 2022.04.07. 12:00 | 13 |
| 2022.04.07. 12:15 | 13 |
| 2022.04.07. 12:30 | 13 |
| 2022.04.07. 12:45 | 13 |
| 2022.04.07. 13:00 | 13 |
| 2022.04.07. 13:15 | 13 |
| 2022.04.07. 13:30 | 13 |
| 2022.04.07. 13:45 | 13 |
| 2022.04.07. 14:00 | 13 |
| 2022.04.07. 14:15 | 13 |
| 2022.04.07. 14:30 | 13 |
| 2022.04.07. 14:45 | 13 |
| 2022.04.07. 15:00 | 13 |
| 2022.04.07. 15:15 | 13 |
| 2022.04.07. 15:30 | 13 |
| 2022.04.07. 15:45 | 13 |
| 2022.04.07. 16:00 | 13 |
| 2022.04.07. 16:15 | 13 |
| 2022.04.07. 16:30 | 13 |
| 2022.04.07. 16:45 | 13 |
| 2022.04.07. 17:00 | 13 |
| 2022.04.07. 17:15 | 13 |
| 2022.04.07. 17:30 | 13 |
| 2022.04.07. 17:45 | 13 |
| 2022.04.07. 18:00 | 13 |
| 2022.04.07. 18:15 | 13 |
| 2022.04.07. 18:30 | 13 |
| 2022.04.07. 18:45 | 13 |
| 2022.04.07. 19:00 | 13 |
| 2022.04.07. 19:15 | 13 |
| 2022.04.07. 19:30 | 13 |
| 2022.04.07. 19:45 | 13 |
| 2022.04.07. 20:00 | 13 |
| 2022.04.07. 20:15 | 13 |
| 2022.04.07. 20:30 | 13 |
| 2022.04.07. 20:45 | 13 |
| 2022.04.07. 21:00 | 13 |
| 2022.04.07. 21:15 | 13 |
| 2022.04.07. 21:30 | 13 |
| 2022.04.07. 21:45 | 13 |
| 2022.04.07. 22:00 | 13 |
| 2022.04.07. 22:15 | 13 |
| 2022.04.07. 22:30 | 13 |
| 2022.04.07. 22:45 | 13 |
| 2022.04.07. 23:00 | 13 |
| 2022.04.07. 23:15 | 13 |
| 2022.04.07. 23:30 | 13 |
| 2022.04.07. 23:45 | 13 |
| 2022.04.08. 00:00 | 13 |
| 2022.04.08. 00:15 | 13 |
| 2022.04.08. 00:30 | 13 |
| 2022.04.08. 00:45 | 13 |
| 2022.04.08. 01:00 | 13 |
| 2022.04.08. 01:15 | 13 |
| 2022.04.08. 01:30 | 13 |
| 2022.04.08. 01:45 | 13 |
| 2022.04.08. 02:00 | 13 |
| 2022.04.08. 02:15 | 13 |
| 2022.04.08. 02:30 | 13 |
| 2022.04.08. 02:45 | 13 |
| 2022.04.08. 03:00 | 13 |
| 2022.04.08. 03:15 | 13 |
| 2022.04.08. 03:30 | 13 |
| 2022.04.08. 03:45 | 13 |
| 2022.04.08. 04:00 | 13 |
| 2022.04.08. 04:15 | 13 |
| 2022.04.08. 04:30 | 13 |
| 2022.04.08. 04:45 | 13 |
| 2022.04.08. 05:00 | 13 |
| 2022.04.08. 05:15 | 13 |
| 2022.04.08. 05:30 | 13 |
| 2022.04.08. 05:45 | 13 |
| 2022.04.08. 06:00 | 13 |
| 2022.04.08. 06:15 | 13 |
| 2022.04.08. 06:30 | 13 |
| 2022.04.08. 06:45 | 13 |
| 2022.04.08. 07:00 | 13 |
| 2022.04.08. 07:15 | 13 |
| 2022.04.08. 07:30 | 13 |
| 2022.04.08. 07:45 | 13 |
| 2022.04.08. 08:00 | 13 |
| 2022.04.08. 08:15 | 13 |
| 2022.04.08. 08:30 | 13 |
| 2022.04.08. 08:45 | 13 |
| 2022.04.08. 09:00 | 13 |
| 2022.04.08. 09:15 | 13 |
| 2022.04.08. 09:30 | 13 |
| 2022.04.08. 09:45 | 13 |
| 2022.04.08. 10:00 | 13 |
| 2022.04.08. 10:15 | 13 |
| 2022.04.08. 10:30 | 13 |
| 2022.04.08. 10:45 | 13 |
| 2022.04.08. 11:00 | 13 |
| 2022.04.08. 11:15 | 13 |
| 2022.04.08. 11:30 | 13 |
| 2022.04.08. 11:45 | 13 |
| 2022.04.08. 12:00 | 13 |
| 2022.04.08. 12:15 | 13 |
| 2022.04.08. 12:30 | 13 |
| 2022.04.08. 12:45 | 13 |
| 2022.04.08. 13:00 | 13 |
| 2022.04.08. 13:15 | 13 |
| 2022.04.08. 13:30 | 13 |
| 2022.04.08. 13:45 | 13 |
| 2022.04.08. 14:00 | 13 |
| 2022.04.08. 14:15 | 13 |
| 2022.04.08. 14:30 | 13 |
| 2022.04.08. 14:45 | 13 |
| 2022.04.08. 15:00 | 13 |
| 2022.04.08. 15:15 | 13 |
| 2022.04.08. 15:30 | 13 |
| 2022.04.08. 15:45 | 13 |
| 2022.04.08. 16:00 | 13 |
| 2022.04.08. 16:15 | 13 |
| 2022.04.08. 16:30 | 13 |
| 2022.04.08. 16:45 | 13 |
| 2022.04.08. 17:00 | 13 |
| 2022.04.08. 17:15 | 13 |
| 2022.04.08. 17:30 | 13 |
| 2022.04.08. 17:45 | 13 |
| 2022.04.08. 18:00 | 13 |
| 2022.04.08. 18:15 | 13 |
| 2022.04.08. 18:30 | 13 |
| 2022.04.08. 18:45 | 13 |
| 2022.04.08. 19:00 | 13 |
| 2022.04.08. 19:15 | 13 |
| 2022.04.08. 19:30 | 13 |
| 2022.04.08. 19:45 | 13 |
| 2022.04.08. 20:00 | 13 |
| 2022.04.08. 20:15 | 13 |
| 2022.04.08. 20:30 | 13 |
| 2022.04.08. 20:45 | 13 |
| 2022.04.08. 21:00 | 13 |
| 2022.04.08. 21:15 | 13 |
| 2022.04.08. 21:30 | 13 |
| 2022.04.08. 21:45 | 13 |
| 2022.04.08. 22:00 | 13 |
| 2022.04.08. 22:15 | 13 |
| 2022.04.08. 22:30 | 13 |
| 2022.04.08. 22:45 | 13 |
| 2022.04.08. 23:00 | 13 |
| 2022.04.08. 23:15 | 13 |
| 2022.04.08. 23:30 | 13 |
| 2022.04.08. 23:45 | 13 |
| 2022.04.09. 00:00 | 13 |
| 2022.04.09. 00:15 | 13 |
| 2022.04.09. 00:30 | 13 |
| 2022.04.09. 00:45 | 13 |
| 2022.04.09. 01:00 | 13 |
| 2022.04.09. 01:15 | 13 |
| 2022.04.09. 01:30 | 13 |
| 2022.04.09. 01:45 | 13 |
| 2022.04.09. 02:00 | 13 |
| 2022.04.09. 02:15 | 13 |
| 2022.04.09. 02:30 | 13 |
| 2022.04.09. 02:45 | 13 |
| 2022.04.09. 03:00 | 13 |
| 2022.04.09. 03:15 | 13 |
| 2022.04.09. 03:30 | 13 |
| 2022.04.09. 03:45 | 13 |
| 2022.04.09. 04:00 | 13 |
| 2022.04.09. 04:15 | 13 |
| 2022.04.09. 04:30 | 13 |
| 2022.04.09. 04:45 | 13 |
| 2022.04.09. 05:00 | 13 |
| 2022.04.09. 05:15 | 13 |
| 2022.04.09. 05:30 | 13 |
| 2022.04.09. 05:45 | 13 |
| 2022.04.09. 06:00 | 13 |
| 2022.04.09. 06:15 | 13 |
| 2022.04.09. 06:30 | 13 |
| 2022.04.09. 06:45 | 13 |
| 2022.04.09. 07:00 | 13 |
| 2022.04.09. 07:15 | 13 |
| 2022.04.09. 07:30 | 13 |
| 2022.04.09. 07:45 | 13 |
| 2022.04.09. 08:00 | 13 |
| 2022.04.09. 08:15 | 13 |
| 2022.04.09. 08:30 | 13 |
| 2022.04.09. 08:45 | 13 |
| 2022.04.09. 09:00 | 13 |
| 2022.04.09. 09:15 | 13 |
| 2022.04.09. 09:30 | 13 |
| 2022.04.09. 09:45 | 13 |
| 2022.04.09. 10:00 | 13 |
| 2022.04.09. 10:15 | 13 |
| 2022.04.09. 10:30 | 13 |
| 2022.04.09. 10:45 | 13 |
| 2022.04.09. 11:00 | 13 |
| 2022.04.09. 11:15 | 13 |
| 2022.04.09. 11:30 | 13 |
| 2022.04.09. 11:45 | 13 |
| 2022.04.09. 12:00 | 13 |
| 2022.04.09. 12:15 | 13 |
| 2022.04.09. 12:30 | 13 |
| 2022.04.09. 12:45 | 13 |
| 2022.04.09. 13:00 | 13 |
| 2022.04.09. 13:15 | 13 |
| 2022.04.09. 13:30 | 13 |
| 2022.04.09. 13:45 | 13 |
| 2022.04.09. 14:00 | 13 |
| 2022.04.09. 14:15 | 13 |
| 2022.04.09. 14:30 | 13 |
| 2022.04.09. 14:45 | 13 |
| 2022.04.09. 15:00 | 13 |
| 2022.04.09. 15:15 | 13 |
| 2022.04.09. 15:30 | 13 |
| 2022.04.09. 15:45 | 13 |
| 2022.04.09. 16:00 | 13 |
| 2022.04.09. 16:15 | 13 |
| 2022.04.09. 16:30 | 13 |
| 2022.04.09. 16:45 | 13 |
| 2022.04.09. 17:00 | 13 |
| 2022.04.09. 17:15 | 13 |
| 2022.04.09. 17:30 | 13 |
| 2022.04.09. 17:45 | 13 |
| 2022.04.09. 18:00 | 13 |
| 2022.04.09. 18:15 | 13 |
| 2022.04.09. 18:30 | 13 |
| 2022.04.09. 18:45 | 13 |
| 2022.04.09. 19:00 | 13 |
| 2022.04.09. 19:15 | 13 |
| 2022.04.09. 19:30 | 13 |
| 2022.04.09. 19:45 | 13 |
| 2022.04.09. 20:00 | 13 |
| 2022.04.09. 20:15 | 13 |
| 2022.04.09. 20:30 | 13 |
| 2022.04.09. 20:45 | 13 |
| 2022.04.09. 21:00 | 13 |
| 2022.04.09. 21:15 | 13 |
| 2022.04.09. 21:30 | 13 |
| 2022.04.09. 21:45 | 13 |
| 2022.04.09. 22:00 | 13 |
| 2022.04.09. 22:15 | 13 |
| 2022.04.09. 22:30 | 13 |
| 2022.04.09. 22:45 | 13 |
| 2022.04.09. 23:00 | 13 |
| 2022.04.09. 23:15 | 13 |
| 2022.04.09. 23:30 | 13 |
| 2022.04.09. 23:45 | 13 |
| 2022.04.10. 00:00 | 13 |
| 2022.04.10. 00:15 | 13 |
| 2022.04.10. 00:30 | 13 |
| 2022.04.10. 00:45 | 13 |
| 2022.04.10. 01:00 | 13 |
| 2022.04.10. 01:15 | 13 |
| 2022.04.10. 01:30 | 13 |
| 2022.04.10. 01:45 | 13 |
| 2022.04.10. 02:00 | 13 |
| 2022.04.10. 02:15 | 13 |
| 2022.04.10. 02:30 | 13 |
| 2022.04.10. 02:45 | 13 |
| 2022.04.10. 03:00 | 13 |
| 2022.04.10. 03:15 | 13 |
| 2022.04.10. 03:30 | 13 |
| 2022.04.10. 03:45 | 13 |
| 2022.04.10. 04:00 | 13 |
| 2022.04.10. 04:15 | 13 |
| 2022.04.10. 04:30 | 13 |
| 2022.04.10. 04:45 | 13 |
| 2022.04.10. 05:00 | 13 |
| 2022.04.10. 05:15 | 13 |
| 2022.04.10. 05:30 | 13 |
| 2022.04.10. 05:45 | 13 |
| 2022.04.10. 06:00 | 13 |
| 2022.04.10. 06:15 | 13 |
| 2022.04.10. 06:30 | 13 |
| 2022.04.10. 06:45 | 13 |
| 2022.04.10. 07:00 | 13 |
| 2022.04.10. 07:15 | 13 |
| 2022.04.10. 07:30 | 13 |
| 2022.04.10. 07:45 | 13 |
| 2022.04.10. 08:00 | 13 |
| 2022.04.10. 08:15 | 13 |
| 2022.04.10. 08:30 | 13 |
| 2022.04.10. 08:45 | 13 |
| 2022.04.10. 09:00 | 13 |
| 2022.04.10. 09:15 | 13 |
| 2022.04.10. 09:30 | 13 |
| 2022.04.10. 09:45 | 13 |
| 2022.04.10. 10:00 | 13 |
| 2022.04.10. 10:15 | 13 |
| 2022.04.10. 10:30 | 13 |
| 2022.04.10. 10:45 | 13 |
| 2022.04.10. 11:00 | 13 |
| 2022.04.10. 11:15 | 13 |
| 2022.04.10. 11:30 | 13 |
| 2022.04.10. 11:45 | 13 |
| 2022.04.10. 12:00 | 13 |
| 2022.04.10. 12:15 | 13 |
| 2022.04.10. 12:30 | 13 |
| 2022.04.10. 12:45 | 13 |
| 2022.04.10. 13:00 | 13 |
| 2022.04.10. 13:15 | 13 |
| 2022.04.10. 13:30 | 13 |
| 2022.04.10. 13:45 | 13 |
| 2022.04.10. 14:00 | 13 |
| 2022.04.10. 14:15 | 13 |
| 2022.04.10. 14:30 | 13 |
| 2022.04.10. 14:45 | 13 |
| 2022.04.10. 15:00 | 13 |
| 2022.04.10. 15:15 | 13 |
| 2022.04.10. 15:30 | 13 |
| 2022.04.10. 15:45 | 13 |
| 2022.04.10. 16:00 | 13 |
| 2022.04.10. 16:15 | 13 |
| 2022.04.10. 16:30 | 13 |
| 2022.04.10. 16:45 | 13 |
| 2022.04.10. 17:00 | 13 |
| 2022.04.10. 17:15 | 13 |
| 2022.04.10. 17:30 | 13 |
| 2022.04.10. 17:45 | 13 |
| 2022.04.10. 18:00 | 13 |
| 2022.04.10. 18:15 | 13 |
| 2022.04.10. 18:30 | 13 |
| 2022.04.10. 18:45 | 13 |
| 2022.04.10. 19:00 | 13 |
| 2022.04.10. 19:15 | 13 |
| 2022.04.10. 19:30 | 13 |
| 2022.04.10. 19:45 | 13 |
| 2022.04.10. 20:00 | 13 |
| 2022.04.10. 20:15 | 13 |
| 2022.04.10. 20:30 | 13 |
| 2022.04.10. 20:45 | 13 |
| 2022.04.10. 21:00 | 13 |
| 2022.04.10. 21:15 | 13 |
| 2022.04.10. 21:30 | 13 |
| 2022.04.10. 21:45 | 13 |
| 2022.04.10. 22:00 | 13 |
| 2022.04.10. 22:15 | 13 |
| 2022.04.10. 22:30 | 13 |
| 2022.04.10. 22:45 | 13 |
| 2022.04.10. 23:00 | 13 |
| 2022.04.10. 23:15 | 13 |
| 2022.04.10. 23:30 | 13 |
| 2022.04.10. 23:45 | 13 |
| 2022.04.11. 00:00 | 13 |
| 2022.04.11. 00:15 | 13 |
| 2022.04.11. 00:30 | 13 |
| 2022.04.11. 00:45 | 13 |
| 2022.04.11. 01:00 | 13 |
| 2022.04.11. 01:15 | 13 |
| 2022.04.11. 01:30 | 13 |
| 2022.04.11. 01:45 | 13 |
| 2022.04.11. 02:00 | 13 |
| 2022.04.11. 02:15 | 13 |
| 2022.04.11. 02:30 | 13 |
| 2022.04.11. 02:45 | 13 |
| 2022.04.11. 03:00 | 13 |
| 2022.04.11. 03:15 | 13 |
| 2022.04.11. 03:30 | 13 |
| 2022.04.11. 03:45 | 13 |
| 2022.04.11. 04:00 | 13 |
| 2022.04.11. 04:15 | 13 |
| 2022.04.11. 04:30 | 13 |
| 2022.04.11. 04:45 | 13 |
| 2022.04.11. 05:00 | 13 |
| 2022.04.11. 05:15 | 13 |
| 2022.04.11. 05:30 | 13 |
| 2022.04.11. 05:45 | 13 |
| 2022.04.11. 06:00 | 13 |
| 2022.04.11. 06:15 | 13 |
| 2022.04.11. 06:30 | 13 |
| 2022.04.11. 06:45 | 13 |
| 2022.04.11. 07:00 | 13 |
| 2022.04.11. 07:15 | 13 |
| 2022.04.11. 07:30 | 13 |
| 2022.04.11. 07:45 | 13 |
| 2022.04.11. 08:00 | 13 |
| 2022.04.11. 08:15 | 13 |
| 2022.04.11. 08:30 | 13 |
| 2022.04.11. 08:45 | 13 |
| 2022.04.11. 09:00 | 13 |
| 2022.04.11. 09:15 | 13 |
| 2022.04.11. 09:30 | 13 |
| 2022.04.11. 09:45 | 13 |
| 2022.04.11. 10:00 | 13 |
| 2022.04.11. 10:15 | 13 |
| 2022.04.11. 10:30 | 13 |
| 2022.04.11. 10:45 | 13 |
| 2022.04.11. 11:00 | 13 |
| 2022.04.11. 11:15 | 13 |
| 2022.04.11. 11:30 | 13 |
| 2022.04.11. 11:45 | 13 |
| 2022.04.11. 12:00 | 13 |
| 2022.04.11. 12:15 | 13 |
| 2022.04.11. 12:30 | 13 |
| 2022.04.11. 12:45 | 13 |
| 2022.04.11. 13:00 | 13 |
| 2022.04.11. 13:15 | 13 |
| 2022.04.11. 13:30 | 13 |
| 2022.04.11. 13:45 | 13 |
| 2022.04.11. 14:00 | 13 |
| 2022.04.11. 14:15 | 13 |
| 2022.04.11. 14:30 | 13 |
| 2022.04.11. 14:45 | 13 |
| 2022.04.11. 15:00 | 13 |
| 2022.04.11. 15:15 | 13 |
| 2022.04.11. 15:30 | 13 |
| 2022.04.11. 15:45 | 13 |
| 2022.04.11. 16:00 | 13 |
| 2022.04.11. 16:15 | 13 |
| 2022.04.11. 16:30 | 13 |
| 2022.04.11. 16:45 | 13 |
| 2022.04.11. 17:00 | 13 |
| 2022.04.11. 17:15 | 13 |
| 2022.04.11. 17:30 | 13 |
| 2022.04.11. 17:45 | 13 |
| 2022.04.11. 18:00 | 13 |
| 2022.04.11. 18:15 | 13 |
| 2022.04.11. 18:30 | 13 |
| 2022.04.11. 18:45 | 13 |
| 2022.04.11. 19:00 | 13 |
| 2022.04.11. 19:15 | 13 |
| 2022.04.11. 19:30 | 13 |
| 2022.04.11. 19:45 | 13 |
| 2022.04.11. 20:00 | 13 |
| 2022.04.11. 20:15 | 13 |
| 2022.04.11. 20:30 | 13 |
| 2022.04.11. 20:45 | 13 |
| 2022.04.11. 21:00 | 13 |
| 2022.04.11. 21:15 | 13 |
| 2022.04.11. 21:30 | 13 |
| 2022.04.11. 21:45 | 13 |
| 2022.04.11. 22:00 | 13 |
| 2022.04.11. 22:15 | 13 |
| 2022.04.11. 22:30 | 13 |
| 2022.04.11. 22:45 | 13 |
| 2022.04.11. 23:00 | 13 |
| 2022.04.11. 23:15 | 13 |
| 2022.04.11. 23:30 | 13 |
| 2022.04.11. 23:45 | 13 |
| 2022.04.12. 00:00 | 13 |
| 2022.04.12. 00:15 | 13 |
| 2022.04.12. 00:30 | 13 |
| 2022.04.12. 00:45 | 13 |
| 2022.04.12. 01:00 | 13 |
| 2022.04.12. 01:15 | 13 |
| 2022.04.12. 01:30 | 13 |
| 2022.04.12. 01:45 | 13 |
| 2022.04.12. 02:00 | 13 |
| 2022.04.12. 02:15 | 13 |
| 2022.04.12. 02:30 | 13 |
| 2022.04.12. 02:45 | 13 |
| 2022.04.12. 03:00 | 13 |
| 2022.04.12. 03:15 | 13 |
| 2022.04.12. 03:30 | 13 |
| 2022.04.12. 03:45 | 13 |
| 2022.04.12. 04:00 | 13 |
| 2022.04.12. 04:15 | 13 |
| 2022.04.12. 04:30 | 13 |
| 2022.04.12. 04:45 | 13 |
| 2022.04.12. 05:00 | 13 |
| 2022.04.12. 05:15 | 13 |
| 2022.04.12. 05:30 | 13 |
| 2022.04.12. 05:45 | 13 |
| 2022.04.12. 06:00 | 13 |
| 2022.04.12. 06:15 | 13 |
| 2022.04.12. 06:30 | 13 |
| 2022.04.12. 06:45 | 13 |
| 2022.04.12. 07:00 | 13 |
| 2022.04.12. 07:15 | 13 |
| 2022.04.12. 07:30 | 13 |
| 2022.04.12. 07:45 | 13 |
| 2022.04.12. 08:00 | 13 |
| 2022.04.12. 08:15 | 13 |
| 2022.04.12. 08:30 | 13 |
| 2022.04.12. 08:45 | 13 |
| 2022.04.12. 09:00 | 13 |
| 2022.04.12. 09:15 | 13 |
| 2022.04.12. 09:30 | 13 |
| 2022.04.12. 09:45 | 13 |
| 2022.04.12. 10:00 | 13 |
| 2022.04.12. 10:15 | 13 |
| 2022.04.12. 10:30 | 13 |
| 2022.04.12. 10:45 | 13 |
| 2022.04.12. 11:00 | 13 |
| 2022.04.12. 11:15 | 13 |
| 2022.04.12. 11:30 | 13 |
| 2022.04.12. 11:45 | 13 |
| 2022.04.12. 12:00 | 13 |
| 2022.04.12. 12:15 | 13 |
| 2022.04.12. 12:30 | 13 |
| 2022.04.12. 12:45 | 13 |
| 2022.04.12. 13:00 | 13 |
| 2022.04.12. 13:15 | 13 |
| 2022.04.12. 13:30 | 13 |
| 2022.04.12. 13:45 | 13 |
| 2022.04.12. 14:00 | 13 |
| 2022.04.12. 14:15 | 13 |
| 2022.04.12. 14:30 | 13 |
| 2022.04.12. 14:45 | 13 |
| 2022.04.12. 15:00 | 13 |
| 2022.04.12. 15:15 | 13 |
| 2022.04.12. 15:30 | 13 |
| 2022.04.12. 15:45 | 13 |
| 2022.04.12. 16:00 | 13 |
| 2022.04.12. 16:15 | 13 |
| 2022.04.12. 16:30 | 13 |
| 2022.04.12. 16:45 | 13 |
| 2022.04.12. 17:00 | 13 |
| 2022.04.12. 17:15 | 13 |
| 2022.04.12. 17:30 | 13 |
| 2022.04.12. 17:45 | 13 |
| 2022.04.12. 18:00 | 13 |
| 2022.04.12. 18:15 | 13 |
| 2022.04.12. 18:30 | 13 |
| 2022.04.12. 18:45 | 13 |
| 2022.04.12. 19:00 | 13 |
| 2022.04.12. 19:15 | 13 |
| 2022.04.12. 19:30 | 13 |
| 2022.04.12. 19:45 | 13 |
| 2022.04.12. 20:00 | 13 |
| 2022.04.12. 20:15 | 13 |
| 2022.04.12. 20:30 | 13 |
| 2022.04.12. 20:45 | 13 |
| 2022.04.12. 21:00 | 13 |
| 2022.04.12. 21:15 | 13 |
| 2022.04.12. 21:30 | 13 |
| 2022.04.12. 21:45 | 13 |
| 2022.04.12. 22:00 | 13 |
| 2022.04.12. 22:15 | 13 |
| 2022.04.12. 22:30 | 13 |
| 2022.04.12. 22:45 | 13 |
| 2022.04.12. 23:00 | 13 |
| 2022.04.12. 23:15 | 13 |
| 2022.04.12. 23:30 | 13 |
| 2022.04.12. 23:45 | 13 |
| 2022.04.13. 00:00 | 13 |
| 2022.04.13. 00:15 | 13 |
| 2022.04.13. 00:30 | 13 |
| 2022.04.13. 00:45 | 13 |
| 2022.04.13. 01:00 | 13 |
| 2022.04.13. 01:15 | 13 |
| 2022.04.13. 01:30 | 13 |
| 2022.04.13. 01:45 | 13 |
| 2022.04.13. 02:00 | 13 |
| 2022.04.13. 02:15 | 13 |
| 2022.04.13. 02:30 | 13 |
| 2022.04.13. 02:45 | 13 |
| 2022.04.13. 03:00 | 13 |
| 2022.04.13. 03:15 | 13 |
| 2022.04.13. 03:30 | 13 |
| 2022.04.13. 03:45 | 13 |
| 2022.04.13. 04:00 | 13 |
| 2022.04.13. 04:15 | 13 |
| 2022.04.13. 04:30 | 13 |
| 2022.04.13. 04:45 | 13 |
| 2022.04.13. 05:00 | 13 |
| 2022.04.13. 05:15 | 13 |
| 2022.04.13. 05:30 | 13 |
| 2022.04.13. 05:45 | 13 |
| 2022.04.13. 06:00 | 13 |
| 2022.04.13. 06:15 | 13 |
| 2022.04.13. 06:30 | 13 |
| 2022.04.13. 06:45 | 13 |
| 2022.04.13. 07:00 | 13 |
| 2022.04.13. 07:15 | 13 |
| 2022.04.13. 07:30 | 13 |
| 2022.04.13. 07:45 | 13 |
| 2022.04.13. 08:00 | 13 |
| 2022.04.13. 08:15 | 13 |
| 2022.04.13. 08:30 | 13 |
| 2022.04.13. 08:45 | 13 |
| 2022.04.13. 09:00 | 13 |
| 2022.04.13. 09:15 | 13 |
| 2022.04.13. 09:30 | 13 |
| 2022.04.13. 09:45 | 13 |
| 2022.04.13. 10:00 | 13 |
| 2022.04.13. 10:15 | 13 |
| 2022.04.13. 10:30 | 13 |
| 2022.04.13. 10:45 | 13 |
| 2022.04.13. 11:00 | 13 |
| 2022.04.13. 11:15 | 13 |
| 2022.04.13. 11:30 | 13 |
| 2022.04.13. 11:45 | 13 |
| 2022.04.13. 12:00 | 13 |
| 2022.04.13. 12:15 | 13 |
| 2022.04.13. 12:30 | 13 |
| 2022.04.13. 12:45 | 13 |
| 2022.04.13. 13:00 | 13 |
| 2022.04.13. 13:15 | 13 |
| 2022.04.13. 13:30 | 13 |
| 2022.04.13. 13:45 | 13 |
| 2022.04.13. 14:00 | 13 |
| 2022.04.13. 14:15 | 13 |
| 2022.04.13. 14:30 | 13 |
| 2022.04.13. 14:45 | 13 |
| 2022.04.13. 15:00 | 13 |
| 2022.04.13. 15:15 | 13 |
| 2022.04.13. 15:30 | 13 |
| 2022.04.13. 15:45 | 13 |
| 2022.04.13. 16:00 | 13 |
| 2022.04.13. 16:15 | 13 |
| 2022.04.13. 16:30 | 13 |
| 2022.04.13. 16:45 | 13 |
| 2022.04.13. 17:00 | 13 |
| 2022.04.13. 17:15 | 13 |
| 2022.04.13. 17:30 | 13 |
| 2022.04.13. 17:45 | 13 |
| 2022.04.13. 18:00 | 13 |
| 2022.04.13. 18:15 | 13 |
| 2022.04.13. 18:30 | 13 |
| 2022.04.13. 18:45 | 13 |
| 2022.04.13. 19:00 | 13 |
| 2022.04.13. 19:15 | 13 |
| 2022.04.13. 19:30 | 13 |
| 2022.04.13. 19:45 | 13 |
| 2022.04.13. 20:00 | 13 |
| 2022.04.13. 20:15 | 13 |
| 2022.04.13. 20:30 | 13 |
| 2022.04.13. 20:45 | 13 |
| 2022.04.13. 21:00 | 13 |
| 2022.04.13. 21:15 | 13 |
| 2022.04.13. 21:30 | 13 |
| 2022.04.13. 21:45 | 13 |
| 2022.04.13. 22:00 | 13 |
| 2022.04.13. 22:15 | 13 |
| 2022.04.13. 22:30 | 13 |
| 2022.04.13. 22:45 | 13 |
| 2022.04.13. 23:00 | 13 |
| 2022.04.13. 23:15 | 13 |
| 2022.04.13. 23:30 | 13 |
| 2022.04.13. 23:45 | 13 |
| 2022.04.14. 00:00 | 13 |
| 2022.04.14. 00:15 | 13 |
| 2022.04.14. 00:30 | 13 |
| 2022.04.14. 00:45 | 13 |
| 2022.04.14. 01:00 | 13 |
| 2022.04.14. 01:15 | 13 |
| 2022.04.14. 01:30 | 13 |
| 2022.04.14. 01:45 | 13 |
| 2022.04.14. 02:00 | 13 |
| 2022.04.14. 02:15 | 13 |
| 2022.04.14. 02:30 | 13 |
| 2022.04.14. 02:45 | 13 |
| 2022.04.14. 03:00 | 13 |
| 2022.04.14. 03:15 | 13 |
| 2022.04.14. 03:30 | 13 |
| 2022.04.14. 03:45 | 13 |
| 2022.04.14. 04:00 | 13 |
| 2022.04.14. 04:15 | 13 |
| 2022.04.14. 04:30 | 13 |
| 2022.04.14. 04:45 | 13 |
| 2022.04.14. 05:00 | 13 |
| 2022.04.14. 05:15 | 13 |
| 2022.04.14. 05:30 | 13 |
| 2022.04.14. 05:45 | 13 |
| 2022.04.14. 06:00 | 13 |
| 2022.04.14. 06:15 | 13 |
| 2022.04.14. 06:30 | 13 |
| 2022.04.14. 06:45 | 13 |
| 2022.04.14. 07:00 | 13 |
| 2022.04.14. 07:15 | 13 |
| 2022.04.14. 07:30 | 13 |
| 2022.04.14. 07:45 | 13 |
| 2022.04.14. 08:00 | 13 |
| 2022.04.14. 08:15 | 13 |
| 2022.04.14. 08:30 | 13 |
| 2022.04.14. 08:45 | 13 |
| 2022.04.14. 09:00 | 13 |
| 2022.04.14. 09:15 | 13 |
| 2022.04.14. 09:30 | 13 |
| 2022.04.14. 09:45 | 13 |
| 2022.04.14. 10:00 | 13 |
| 2022.04.14. 10:15 | 13 |
| 2022.04.14. 10:30 | 13 |
| 2022.04.14. 10:45 | 13 |
| 2022.04.14. 11:00 | 13 |
| 2022.04.14. 11:15 | 13 |
| 2022.04.14. 11:30 | 13 |
| 2022.04.14. 11:45 | 13 |
| 2022.04.14. 12:00 | 13 |
| 2022.04.14. 12:15 | 13 |
| 2022.04.14. 12:30 | 13 |
| 2022.04.14. 12:45 | 13 |
| 2022.04.14. 13:00 | 13 |
| 2022.04.14. 13:15 | 13 |
| 2022.04.14. 13:30 | 13 |
| 2022.04.14. 13:45 | 13 |
| 2022.04.14. 14:00 | 13 |
| 2022.04.14. 14:15 | 13 |
| 2022.04.14. 14:30 | 13 |
| 2022.04.14. 14:45 | 13 |
| 2022.04.14. 15:00 | 13 |
| 2022.04.14. 15:15 | 13 |
| 2022.04.14. 15:30 | 13 |
| 2022.04.14. 15:45 | 13 |
| 2022.04.14. 16:00 | 13 |
| 2022.04.14. 16:15 | 13 |
| 2022.04.14. 16:30 | 13 |
| 2022.04.14. 16:45 | 13 |
| 2022.04.14. 17:00 | 13 |
| 2022.04.14. 17:15 | 13 |
| 2022.04.14. 17:30 | 13 |
| 2022.04.14. 17:45 | 13 |
| 2022.04.14. 18:00 | 13 |
| 2022.04.14. 18:15 | 13 |
| 2022.04.14. 18:30 | 13 |
| 2022.04.14. 18:45 | 13 |
| 2022.04.14. 19:00 | 13 |
| 2022.04.14. 19:15 | 13 |
| 2022.04.14. 19:30 | 13 |
| 2022.04.14. 19:45 | 13 |
| 2022.04.14. 20:00 | 13 |
| 2022.04.14. 20:15 | 13 |
| 2022.04.14. 20:30 | 13 |
| 2022.04.14. 20:45 | 13 |
| 2022.04.14. 21:00 | 13 |
| 2022.04.14. 21:15 | 13 |
| 2022.04.14. 21:30 | 13 |
| 2022.04.14. 21:45 | 13 |
| 2022.04.14. 22:00 | 13 |
| 2022.04.14. 22:15 | 13 |
| 2022.04.14. 22:30 | 13 |
| 2022.04.14. 22:45 | 13 |
| 2022.04.14. 23:00 | 13 |
| 2022.04.14. 23:15 | 13 |
| 2022.04.14. 23:30 | 13 |
| 2022.04.14. 23:45 | 13 |
| 2022.04.15. 00:00 | 13 |
| 2022.04.15. 00:15 | 13 |
| 2022.04.15. 00:30 | 13 |
| 2022.04.15. 00:45 | 13 |
| 2022.04.15. 01:00 | 13 |
| 2022.04.15. 01:15 | 13 |
| 2022.04.15. 01:30 | 13 |
| 2022.04.15. 01:45 | 13 |
| 2022.04.15. 02:00 | 13 |
| 2022.04.15. 02:15 | 13 |
| 2022.04.15. 02:30 | 13 |
| 2022.04.15. 02:45 | 13 |
| 2022.04.15. 03:00 | 13 |
| 2022.04.15. 03:15 | 13 |
| 2022.04.15. 03:30 | 13 |
| 2022.04.15. 03:45 | 13 |
| 2022.04.15. 04:00 | 13 |
| 2022.04.15. 04:15 | 13 |
| 2022.04.15. 04:30 | 13 |
| 2022.04.15. 04:45 | 13 |
| 2022.04.15. 05:00 | 13 |
| 2022.04.15. 05:15 | 13 |
| 2022.04.15. 05:30 | 13 |
| 2022.04.15. 05:45 | 13 |
| 2022.04.15. 06:00 | 13 |
| 2022.04.15. 06:15 | 13 |
| 2022.04.15. 06:30 | 13 |
| 2022.04.15. 06:45 | 13 |
| 2022.04.15. 07:00 | 13 |
| 2022.04.15. 07:15 | 13 |
| 2022.04.15. 07:30 | 13 |
| 2022.04.15. 07:45 | 13 |
| 2022.04.15. 08:00 | 13 |
| 2022.04.15. 08:15 | 13 |
| 2022.04.15. 08:30 | 13 |
| 2022.04.15. 08:45 | 13 |
| 2022.04.15. 09:00 | 13 |
| 2022.04.15. 09:15 | 13 |
| 2022.04.15. 09:30 | 13 |
| 2022.04.15. 09:45 | 13 |
| 2022.04.15. 10:00 | 13 |
| 2022.04.15. 10:15 | 13 |
| 2022.04.15. 10:30 | 13 |
| 2022.04.15. 10:45 | 13 |
| 2022.04.15. 11:00 | 13 |
| 2022.04.15. 11:15 | 13 |
| 2022.04.15. 11:30 | 13 |
| 2022.04.15. 11:45 | 13 |
| 2022.04.15. 12:00 | 13 |
| 2022.04.15. 12:15 | 13 |
| 2022.04.15. 12:30 | 13 |
| 2022.04.15. 12:45 | 13 |
| 2022.04.15. 13:00 | 13 |
| 2022.04.15. 13:15 | 13 |
| 2022.04.15. 13:30 | 13 |
| 2022.04.15. 13:45 | 13 |
| 2022.04.15. 14:00 | 13 |
| 2022.04.15. 14:15 | 13 |
| 2022.04.15. 14:30 | 13 |
| 2022.04.15. 14:45 | 13 |
| 2022.04.15. 15:00 | 13 |
| 2022.04.15. 15:15 | 13 |
| 2022.04.15. 15:30 | 13 |
| 2022.04.15. 15:45 | 13 |
| 2022.04.15. 16:00 | 13 |
| 2022.04.15. 16:15 | 13 |
| 2022.04.15. 16:30 | 13 |
| 2022.04.15. 16:45 | 13 |
| 2022.04.15. 17:00 | 13 |
| 2022.04.15. 17:15 | 13 |
| 2022.04.15. 17:30 | 13 |
| 2022.04.15. 17:45 | 13 |
| 2022.04.15. 18:00 | 13 |
| 2022.04.15. 18:15 | 13 |
| 2022.04.15. 18:30 | 13 |
| 2022.04.15. 18:45 | 13 |
| 2022.04.15. 19:00 | 13 |
| 2022.04.15. 19:15 | 13 |
| 2022.04.15. 19:30 | 13 |
| 2022.04.15. 19:45 | 13 |
| 2022.04.15. 20:00 | 13 |
| 2022.04.15. 20:15 | 13 |
| 2022.04.15. 20:30 | 13 |
| 2022.04.15. 20:45 | 13 |
| 2022.04.15. 21:00 | 13 |
| 2022.04.15. 21:15 | 13 |
| 2022.04.15. 21:30 | 13 |
| 2022.04.15. 21:45 | 13 |
| 2022.04.15. 22:00 | 13 |
| 2022.04.15. 22:15 | 13 |
| 2022.04.15. 22:30 | 13 |
| 2022.04.15. 22:45 | 13 |
| 2022.04.15. 23:00 | 13 |
| 2022.04.15. 23:15 | 13 |
| 2022.04.15. 23:30 | 13 |
| 2022.04.15. 23:45 | 13 |
| 2022.04.16. 00:00 | 13 |
| 2022.04.16. 00:15 | 13 |
| 2022.04.16. 00:30 | 13 |
| 2022.04.16. 00:45 | 13 |
| 2022.04.16. 01:00 | 13 |
| 2022.04.16. 01:15 | 13 |
| 2022.04.16. 01:30 | 13 |
| 2022.04.16. 01:45 | 13 |
| 2022.04.16. 02:00 | 13 |
| 2022.04.16. 02:15 | 13 |
| 2022.04.16. 02:30 | 13 |
| 2022.04.16. 02:45 | 13 |
| 2022.04.16. 03:00 | 13 |
| 2022.04.16. 03:15 | 13 |
| 2022.04.16. 03:30 | 13 |
| 2022.04.16. 03:45 | 13 |
| 2022.04.16. 04:00 | 13 |
| 2022.04.16. 04:15 | 13 |
| 2022.04.16. 04:30 | 13 |
| 2022.04.16. 04:45 | 13 |
| 2022.04.16. 05:00 | 13 |
| 2022.04.16. 05:15 | 13 |
| 2022.04.16. 05:30 | 13 |
| 2022.04.16. 05:45 | 13 |
| 2022.04.16. 06:00 | 13 |
| 2022.04.16. 06:15 | 13 |
| 2022.04.16. 06:30 | 13 |
| 2022.04.16. 06:45 | 13 |
| 2022.04.16. 07:00 | 13 |
| 2022.04.16. 07:15 | 13 |
| 2022.04.16. 07:30 | 13 |
| 2022.04.16. 07:45 | 13 |
| 2022.04.16. 08:00 | 13 |
| 2022.04.16. 08:15 | 13 |
| 2022.04.16. 08:30 | 13 |
| 2022.04.16. 08:45 | 13 |
| 2022.04.16. 09:00 | 13 |
| 2022.04.16. 09:15 | 13 |
| 2022.04.16. 09:30 | 13 |
| 2022.04.16. 09:45 | 13 |
| 2022.04.16. 10:00 | 13 |
| 2022.04.16. 10:15 | 13 |
| 2022.04.16. 10:30 | 13 |
| 2022.04.16. 10:45 | 13 |
| 2022.04.16. 11:00 | 13 |
| 2022.04.16. 11:15 | 13 |
| 2022.04.16. 11:30 | 13 |
| 2022.04.16. 11:45 | 13 |
| 2022.04.16. 12:00 | 13 |
| 2022.04.16. 12:15 | 13 |
| 2022.04.16. 12:30 | 13 |
| 2022.04.16. 12:45 | 13 |
| 2022.04.16. 13:00 | 13 |
| 2022.04.16. 13:15 | 13 |
| 2022.04.16. 13:30 | 13 |
| 2022.04.16. 13:45 | 13 |
| 2022.04.16. 14:00 | 13 |
| 2022.04.16. 14:15 | 13 |
| 2022.04.16. 14:30 | 13 |
| 2022.04.16. 14:45 | 13 |
| 2022.04.16. 15:00 | 13 |
| 2022.04.16. 15:15 | 13 |
| 2022.04.16. 15:30 | 13 |
| 2022.04.16. 15:45 | 13 |
| 2022.04.16. 16:00 | 13 |
| 2022.04.16. 16:15 | 13 |
| 2022.04.16. 16:30 | 13 |
| 2022.04.16. 16:45 | 13 |
| 2022.04.16. 17:00 | 13 |
| 2022.04.16. 17:15 | 13 |
| 2022.04.16. 17:30 | 13 |
| 2022.04.16. 17:45 | 13 |
| 2022.04.16. 18:00 | 13 |
| 2022.04.16. 18:15 | 13 |
| 2022.04.16. 18:30 | 13 |
| 2022.04.16. 18:45 | 13 |
| 2022.04.16. 19:00 | 13 |
| 2022.04.16. 19:15 | 13 |
| 2022.04.16. 19:30 | 13 |
| 2022.04.16. 19:45 | 13 |
| 2022.04.16. 20:00 | 13 |
| 2022.04.16. 20:15 | 13 |
| 2022.04.16. 20:30 | 13 |
| 2022.04.16. 20:45 | 13 |
| 2022.04.16. 21:00 | 13 |
| 2022.04.16. 21:15 | 13 |
| 2022.04.16. 21:30 | 13 |
| 2022.04.16. 21:45 | 13 |
| 2022.04.16. 22:00 | 13 |
| 2022.04.16. 22:15 | 13 |
| 2022.04.16. 22:30 | 13 |
| 2022.04.16. 22:45 | 13 |
| 2022.04.16. 23:00 | 13 |
| 2022.04.16. 23:15 | 13 |
| 2022.04.16. 23:30 | 13 |
| 2022.04.16. 23:45 | 13 |
| 2022.04.17. 00:00 | 13 |
| 2022.04.17. 00:15 | 13 |
| 2022.04.17. 00:30 | 13 |
| 2022.04.17. 00:45 | 13 |
| 2022.04.17. 01:00 | 13 |
| 2022.04.17. 01:15 | 13 |
| 2022.04.17. 01:30 | 13 |
| 2022.04.17. 01:45 | 13 |
| 2022.04.17. 02:00 | 13 |
| 2022.04.17. 02:15 | 13 |
| 2022.04.17. 02:30 | 13 |
| 2022.04.17. 02:45 | 13 |
| 2022.04.17. 03:00 | 13 |
| 2022.04.17. 03:15 | 13 |
| 2022.04.17. 03:30 | 13 |
| 2022.04.17. 03:45 | 13 |
| 2022.04.17. 04:00 | 13 |
| 2022.04.17. 04:15 | 13 |
| 2022.04.17. 04:30 | 13 |
| 2022.04.17. 04:45 | 13 |
| 2022.04.17. 05:00 | 13 |
| 2022.04.17. 05:15 | 13 |
| 2022.04.17. 05:30 | 13 |
| 2022.04.17. 05:45 | 13 |
| 2022.04.17. 06:00 | 13 |
| 2022.04.17. 06:15 | 13 |
| 2022.04.17. 06:30 | 13 |
| 2022.04.17. 06:45 | 13 |
| 2022.04.17. 07:00 | 13 |
| 2022.04.17. 07:15 | 13 |
| 2022.04.17. 07:30 | 13 |
| 2022.04.17. 07:45 | 13 |
| 2022.04.17. 08:00 | 13 |
| 2022.04.17. 08:15 | 13 |
| 2022.04.17. 08:30 | 13 |
| 2022.04.17. 08:45 | 13 |
| 2022.04.17. 09:00 | 13 |
| 2022.04.17. 09:15 | 13 |
| 2022.04.17. 09:30 | 13 |
| 2022.04.17. 09:45 | 13 |
| 2022.04.17. 10:00 | 13 |
| 2022.04.17. 10:15 | 13 |
| 2022.04.17. 10:30 | 13 |
| 2022.04.17. 10:45 | 13 |
| 2022.04.17. 11:00 | 13 |
| 2022.04.17. 11:15 | 13 |
| 2022.04.17. 11:30 | 13 |
| 2022.04.17. 11:45 | 13 |
| 2022.04.17. 12:00 | 13 |
| 2022.04.17. 12:15 | 13 |
| 2022.04.17. 12:30 | 13 |
| 2022.04.17. 12:45 | 13 |
| 2022.04.17. 13:00 | 13 |
| 2022.04.17. 13:15 | 13 |
| 2022.04.17. 13:30 | 13 |
| 2022.04.17. 13:45 | 13 |
| 2022.04.17. 14:00 | 13 |
| 2022.04.17. 14:15 | 13 |
| 2022.04.17. 14:30 | 13 |
| 2022.04.17. 14:45 | 13 |
| 2022.04.17. 15:00 | 13 |
| 2022.04.17. 15:15 | 13 |
| 2022.04.17. 15:30 | 13 |
| 2022.04.17. 15:45 | 13 |
| 2022.04.17. 16:00 | 13 |
| 2022.04.17. 16:15 | 13 |
| 2022.04.17. 16:30 | 13 |
| 2022.04.17. 16:45 | 13 |
| 2022.04.17. 17:00 | 13 |
| 2022.04.17. 17:15 | 13 |
| 2022.04.17. 17:30 | 13 |
| 2022.04.17. 17:45 | 13 |
| 2022.04.17. 18:00 | 13 |
| 2022.04.17. 18:15 | 13 |
| 2022.04.17. 18:30 | 13 |
| 2022.04.17. 18:45 | 13 |
| 2022.04.17. 19:00 | 13 |
| 2022.04.17. 19:15 | 13 |
| 2022.04.17. 19:30 | 13 |
| 2022.04.17. 19:45 | 13 |
| 2022.04.17. 20:00 | 13 |
| 2022.04.17. 20:15 | 13 |
| 2022.04.17. 20:30 | 13 |
| 2022.04.17. 20:45 | 13 |
| 2022.04.17. 21:00 | 13 |
| 2022.04.17. 21:15 | 13 |
| 2022.04.17. 21:30 | 13 |
| 2022.04.17. 21:45 | 13 |
| 2022.04.17. 22:00 | 13 |
| 2022.04.17. 22:15 | 13 |
| 2022.04.17. 22:30 | 13 |
| 2022.04.17. 22:45 | 13 |
| 2022.04.17. 23:00 | 13 |
| 2022.04.17. 23:15 | 13 |
| 2022.04.17. 23:30 | 13 |
| 2022.04.17. 23:45 | 13 |
| 2022.04.18. 00:00 | 13 |
| 2022.04.18. 00:15 | 13 |
| 2022.04.18. 00:30 | 13 |
| 2022.04.18. 00:45 | 13 |
| 2022.04.18. 01:00 | 13 |
| 2022.04.18. 01:15 | 13 |
| 2022.04.18. 01:30 | 13 |
| 2022.04.18. 01:45 | 13 |
| 2022.04.18. 02:00 | 13 |
| 2022.04.18. 02:15 | 13 |
| 2022.04.18. 02:30 | 13 |
| 2022.04.18. 02:45 | 13 |
| 2022.04.18. 03:00 | 13 |
| 2022.04.18. 03:15 | 13 |
| 2022.04.18. 03:30 | 13 |
| 2022.04.18. 03:45 | 13 |
| 2022.04.18. 04:00 | 13 |
| 2022.04.18. 04:15 | 13 |
| 2022.04.18. 04:30 | 13 |
| 2022.04.18. 04:45 | 13 |
| 2022.04.18. 05:00 | 13 |
| 2022.04.18. 05:15 | 13 |
| 2022.04.18. 05:30 | 13 |
| 2022.04.18. 05:45 | 13 |
| 2022.04.18. 06:00 | 13 |
| 2022.04.18. 06:15 | 13 |
| 2022.04.18. 06:30 | 13 |
| 2022.04.18. 06:45 | 13 |
| 2022.04.18. 07:00 | 13 |
| 2022.04.18. 07:15 | 13 |
| 2022.04.18. 07:30 | 13 |
| 2022.04.18. 07:45 | 13 |
| 2022.04.18. 08:00 | 13 |
| 2022.04.18. 08:15 | 13 |
| 2022.04.18. 08:30 | 13 |
| 2022.04.18. 08:45 | 13 |
| 2022.04.18. 09:00 | 13 |
| 2022.04.18. 09:15 | 13 |
| 2022.04.18. 09:30 | 13 |
| 2022.04.18. 09:45 | 13 |
| 2022.04.18. 10:00 | 13 |
| 2022.04.18. 10:15 | 13 |
| 2022.04.18. 10:30 | 13 |
| 2022.04.18. 10:45 | 13 |
| 2022.04.18. 11:00 | 13 |
| 2022.04.18. 11:15 | 13 |
| 2022.04.18. 11:30 | 13 |
| 2022.04.18. 11:45 | 13 |
| 2022.04.18. 12:00 | 13 |
| 2022.04.18. 12:15 | 13 |
| 2022.04.18. 12:30 | 13 |
| 2022.04.18. 12:45 | 13 |
| 2022.04.18. 13:00 | 13 |
| 2022.04.18. 13:15 | 13 |
| 2022.04.18. 13:30 | 13 |
| 2022.04.18. 13:45 | 13 |
| 2022.04.18. 14:00 | 13 |
| 2022.04.18. 14:15 | 13 |
| 2022.04.18. 14:30 | 13 |
| 2022.04.18. 14:45 | 13 |
| 2022.04.18. 15:00 | 13 |
| 2022.04.18. 15:15 | 13 |
| 2022.04.18. 15:30 | 13 |
| 2022.04.18. 15:45 | 13 |
| 2022.04.18. 16:00 | 13 |
| 2022.04.18. 16:15 | 13 |
| 2022.04.18. 16:30 | 13 |
| 2022.04.18. 16:45 | 13 |
| 2022.04.18. 17:00 | 13 |
| 2022.04.18. 17:15 | 13 |
| 2022.04.18. 17:30 | 13 |
| 2022.04.18. 17:45 | 13 |
| 2022.04.18. 18:00 | 13 |
| 2022.04.18. 18:15 | 13 |
| 2022.04.18. 18:30 | 13 |
| 2022.04.18. 18:45 | 13 |
| 2022.04.18. 19:00 | 13 |
| 2022.04.18. 19:15 | 13 |
| 2022.04.18. 19:30 | 13 |
| 2022.04.18. 19:45 | 13 |
| 2022.04.18. 20:00 | 13 |
| 2022.04.18. 20:15 | 13 |
| 2022.04.18. 20:30 | 13 |
| 2022.04.18. 20:45 | 13 |
| 2022.04.18. 21:00 | 13 |
| 2022.04.18. 21:15 | 13 |
| 2022.04.18. 21:30 | 13 |
| 2022.04.18. 21:45 | 13 |
| 2022.04.18. 22:00 | 13 |
| 2022.04.18. 22:15 | 13 |
| 2022.04.18. 22:30 | 13 |
| 2022.04.18. 22:45 | 13 |
| 2022.04.18. 23:00 | 13 |
| 2022.04.18. 23:15 | 13 |
| 2022.04.18. 23:30 | 13 |
| 2022.04.18. 23:45 | 13 |
| 2022.04.19. 00:00 | 13 |
| 2022.04.19. 00:15 | 13 |
| 2022.04.19. 00:30 | 13 |
| 2022.04.19. 00:45 | 13 |
| 2022.04.19. 01:00 | 13 |
| 2022.04.19. 01:15 | 13 |
| 2022.04.19. 01:30 | 13 |
| 2022.04.19. 01:45 | 13 |
| 2022.04.19. 02:00 | 13 |
| 2022.04.19. 02:15 | 13 |
| 2022.04.19. 02:30 | 13 |
| 2022.04.19. 02:45 | 13 |
| 2022.04.19. 03:00 | 13 |
| 2022.04.19. 03:15 | 13 |
| 2022.04.19. 03:30 | 13 |
| 2022.04.19. 03:45 | 13 |
| 2022.04.19. 04:00 | 13 |
| 2022.04.19. 04:15 | 13 |
| 2022.04.19. 04:30 | 13 |
| 2022.04.19. 04:45 | 13 |
| 2022.04.19. 05:00 | 13 |
| 2022.04.19. 05:15 | 13 |
| 2022.04.19. 05:30 | 13 |
| 2022.04.19. 05:45 | 13 |
| 2022.04.19. 06:00 | 13 |
| 2022.04.19. 06:15 | 13 |
| 2022.04.19. 06:30 | 13 |
| 2022.04.19. 06:45 | 13 |
| 2022.04.19. 07:00 | 13 |
| 2022.04.19. 07:15 | 13 |
| 2022.04.19. 07:30 | 13 |
| 2022.04.19. 07:45 | 13 |
| 2022.04.19. 08:00 | 13 |
| 2022.04.19. 08:15 | 13 |
| 2022.04.19. 08:30 | 13 |
| 2022.04.19. 08:45 | 13 |
| 2022.04.19. 09:00 | 13 |
| 2022.04.19. 09:15 | 13 |
| 2022.04.19. 09:30 | 13 |
| 2022.04.19. 09:45 | 13 |
| 2022.04.19. 10:00 | 13 |
| 2022.04.19. 10:15 | 13 |
| 2022.04.19. 10:30 | 13 |
| 2022.04.19. 10:45 | 13 |
| 2022.04.19. 11:00 | 13 |
| 2022.04.19. 11:15 | 13 |
| 2022.04.19. 11:30 | 13 |
| 2022.04.19. 11:45 | 13 |
| 2022.04.19. 12:00 | 13 |
| 2022.04.19. 12:15 | 13 |
| 2022.04.19. 12:30 | 13 |
| 2022.04.19. 12:45 | 13 |
| 2022.04.19. 13:00 | 13 |
| 2022.04.19. 13:15 | 13 |
| 2022.04.19. 13:30 | 13 |
| 2022.04.19. 13:45 | 13 |
| 2022.04.19. 14:00 | 13 |
| 2022.04.19. 14:15 | 13 |
| 2022.04.19. 14:30 | 13 |
| 2022.04.19. 14:45 | 13 |
| 2022.04.19. 15:00 | 13 |
| 2022.04.19. 15:15 | 13 |
| 2022.04.19. 15:30 | 13 |
| 2022.04.19. 15:45 | 13 |
| 2022.04.19. 16:00 | 13 |
| 2022.04.19. 16:15 | 13 |
| 2022.04.19. 16:30 | 13 |
| 2022.04.19. 16:45 | 13 |
| 2022.04.19. 17:00 | 13 |
| 2022.04.19. 17:15 | 13 |
| 2022.04.19. 17:30 | 13 |
| 2022.04.19. 17:45 | 13 |
| 2022.04.19. 18:00 | 13 |
| 2022.04.19. 18:15 | 13 |
| 2022.04.19. 18:30 | 13 |
| 2022.04.19. 18:45 | 13 |
| 2022.04.19. 19:00 | 13 |
| 2022.04.19. 19:15 | 13 |
| 2022.04.19. 19:30 | 13 |
| 2022.04.19. 19:45 | 13 |
| 2022.04.19. 20:00 | 13 |
| 2022.04.19. 20:15 | 13 |
| 2022.04.19. 20:30 | 13 |
| 2022.04.19. 20:45 | 13 |
| 2022.04.19. 21:00 | 13 |
| 2022.04.19. 21:15 | 13 |
| 2022.04.19. 21:30 | 13 |
| 2022.04.19. 21:45 | 13 |
| 2022.04.19. 22:00 | 13 |
| 2022.04.19. 22:15 | 13 |
| 2022.04.19. 22:30 | 13 |
| 2022.04.19. 22:45 | 13 |
| 2022.04.19. 23:00 | 13 |
| 2022.04.19. 23:15 | 13 |
| 2022.04.19. 23:30 | 13 |
| 2022.04.19. 23:45 | 13 |
| 2022.04.20. 00:00 | 13 |
| 2022.04.20. 00:15 | 13 |
| 2022.04.20. 00:30 | 13 |
| 2022.04.20. 00:45 | 13 |
| 2022.04.20. 01:00 | 13 |
| 2022.04.20. 01:15 | 13 |
| 2022.04.20. 01:30 | 13 |
| 2022.04.20. 01:45 | 13 |
| 2022.04.20. 02:00 | 13 |
| 2022.04.20. 02:15 | 13 |
| 2022.04.20. 02:30 | 13 |
| 2022.04.20. 02:45 | 13 |
| 2022.04.20. 03:00 | 13 |
| 2022.04.20. 03:15 | 13 |
| 2022.04.20. 03:30 | 13 |
| 2022.04.20. 03:45 | 13 |
| 2022.04.20. 04:00 | 13 |
| 2022.04.20. 04:15 | 13 |
| 2022.04.20. 04:30 | 13 |
| 2022.04.20. 04:45 | 13 |
| 2022.04.20. 05:00 | 13 |
| 2022.04.20. 05:15 | 13 |
| 2022.04.20. 05:30 | 13 |
| 2022.04.20. 05:45 | 13 |
| 2022.04.20. 06:00 | 13 |
| 2022.04.20. 06:15 | 13 |
| 2022.04.20. 06:30 | 13 |
| 2022.04.20. 06:45 | 13 |
| 2022.04.20. 07:00 | 13 |
| 2022.04.20. 07:15 | 13 |
| 2022.04.20. 07:30 | 13 |
| 2022.04.20. 07:45 | 13 |
| 2022.04.20. 08:00 | 13 |
| 2022.04.20. 08:15 | 13 |
| 2022.04.20. 08:30 | 13 |
| 2022.04.20. 08:45 | 13 |
| 2022.04.20. 09:00 | 13 |
| 2022.04.20. 09:15 | 13 |
| 2022.04.20. 09:30 | 13 |
| 2022.04.20. 09:45 | 13 |
| 2022.04.20. 10:00 | 13 |
| 2022.04.20. 10:15 | 13 |
| 2022.04.20. 10:30 | 13 |
| 2022.04.20. 10:45 | 13 |
| 2022.04.20. 11:00 | 13 |
| 2022.04.20. 11:15 | 13 |
| 2022.04.20. 11:30 | 13 |
| 2022.04.20. 11:45 | 13 |
| 2022.04.20. 12:00 | 13 |
| 2022.04.20. 12:15 | 13 |
| 2022.04.20. 12:30 | 13 |
| 2022.04.20. 12:45 | 13 |
| 2022.04.20. 13:00 | 13 |
| 2022.04.20. 13:15 | 13 |
| 2022.04.20. 13:30 | 13 |
| 2022.04.20. 13:45 | 13 |
| 2022.04.20. 14:00 | 13 |
| 2022.04.20. 14:15 | 13 |
| 2022.04.20. 14:30 | 13 |
| 2022.04.20. 14:45 | 13 |
| 2022.04.20. 15:00 | 13 |
| 2022.04.20. 15:15 | 13 |
| 2022.04.20. 15:30 | 13 |
| 2022.04.20. 15:45 | 13 |
| 2022.04.20. 16:00 | 13 |
| 2022.04.20. 16:15 | 13 |
| 2022.04.20. 16:30 | 13 |
| 2022.04.20. 16:45 | 13 |
| 2022.04.20. 17:00 | 13 |
| 2022.04.20. 17:15 | 13 |
| 2022.04.20. 17:30 | 13 |
| 2022.04.20. 17:45 | 13 |
| 2022.04.20. 18:00 | 13 |
| 2022.04.20. 18:15 | 13 |
| 2022.04.20. 18:30 | 13 |
| 2022.04.20. 18:45 | 13 |
| 2022.04.20. 19:00 | 13 |
| 2022.04.20. 19:15 | 13 |
| 2022.04.20. 19:30 | 13 |
| 2022.04.20. 19:45 | 13 |
| 2022.04.20. 20:00 | 13 |
| 2022.04.20. 20:15 | 13 |
| 2022.04.20. 20:30 | 13 |
| 2022.04.20. 20:45 | 13 |
| 2022.04.20. 21:00 | 13 |
| 2022.04.20. 21:15 | 13 |
| 2022.04.20. 21:30 | 13 |
| 2022.04.20. 21:45 | 13 |
| 2022.04.20. 22:00 | 13 |
| 2022.04.20. 22:15 | 13 |
| 2022.04.20. 22:30 | 13 |
| 2022.04.20. 22:45 | 13 |
| 2022.04.20. 23:00 | 13 |
| 2022.04.20. 23:15 | 13 |
| 2022.04.20. 23:30 | 13 |
| 2022.04.20. 23:45 | 13 |
| 2022.04.21. 00:00 | 13 |
| 2022.04.21. 00:15 | 13 |
| 2022.04.21. 00:30 | 13 |
| 2022.04.21. 00:45 | 13 |
| 2022.04.21. 01:00 | 13 |
| 2022.04.21. 01:15 | 13 |
| 2022.04.21. 01:30 | 13 |
| 2022.04.21. 01:45 | 13 |
| 2022.04.21. 02:00 | 13 |
| 2022.04.21. 02:15 | 13 |
| 2022.04.21. 02:30 | 13 |
| 2022.04.21. 02:45 | 13 |
| 2022.04.21. 03:00 | 13 |
| 2022.04.21. 03:15 | 13 |
| 2022.04.21. 03:30 | 13 |
| 2022.04.21. 03:45 | 13 |
| 2022.04.21. 04:00 | 13 |
| 2022.04.21. 04:15 | 13 |
| 2022.04.21. 04:30 | 13 |
| 2022.04.21. 04:45 | 13 |
| 2022.04.21. 05:00 | 13 |
| 2022.04.21. 05:15 | 13 |
| 2022.04.21. 05:30 | 13 |
| 2022.04.21. 05:45 | 13 |
| 2022.04.21. 06:00 | 13 |
| 2022.04.21. 06:15 | 13 |
| 2022.04.21. 06:30 | 13 |
| 2022.04.21. 06:45 | 13 |
| 2022.04.21. 07:00 | 13 |
| 2022.04.21. 07:15 | 13 |
| 2022.04.21. 07:30 | 13 |
| 2022.04.21. 07:45 | 13 |
| 2022.04.21. 08:00 | 13 |
| 2022.04.21. 08:15 | 13 |
| 2022.04.21. 08:30 | 13 |
| 2022.04.21. 08:45 | 13 |
| 2022.04.21. 09:00 | 13 |
| 2022.04.21. 09:15 | 13 |
| 2022.04.21. 09:30 | 13 |
| 2022.04.21. 09:45 | 13 |
| 2022.04.21. 10:00 | 13 |
| 2022.04.21. 10:15 | 13 |
| 2022.04.21. 10:30 | 13 |
| 2022.04.21. 10:45 | 13 |
| 2022.04.21. 11:00 | 13 |
| 2022.04.21. 11:15 | 13 |
| 2022.04.21. 11:30 | 13 |
| 2022.04.21. 11:45 | 13 |
| 2022.04.21. 12:00 | 13 |
| 2022.04.21. 12:15 | 13 |
| 2022.04.21. 12:30 | 13 |
| 2022.04.21. 12:45 | 13 |
| 2022.04.21. 13:00 | 13 |
| 2022.04.21. 13:15 | 13 |
| 2022.04.21. 13:30 | 13 |
| 2022.04.21. 13:45 | 13 |
| 2022.04.21. 14:00 | 13 |
| 2022.04.21. 14:15 | 13 |
| 2022.04.21. 14:30 | 13 |
| 2022.04.21. 14:45 | 13 |
| 2022.04.21. 15:00 | 13 |
| 2022.04.21. 15:15 | 13 |
| 2022.04.21. 15:30 | 13 |
| 2022.04.21. 15:45 | 13 |
| 2022.04.21. 16:00 | 13 |
| 2022.04.21. 16:15 | 13 |
| 2022.04.21. 16:30 | 13 |
| 2022.04.21. 16:45 | 13 |
| 2022.04.21. 17:00 | 13 |
| 2022.04.21. 17:15 | 13 |
| 2022.04.21. 17:30 | 13 |
| 2022.04.21. 17:45 | 13 |
| 2022.04.21. 18:00 | 13 |
| 2022.04.21. 18:15 | 13 |
| 2022.04.21. 18:30 | 13 |
| 2022.04.21. 18:45 | 13 |
| 2022.04.21. 19:00 | 13 |
| 2022.04.21. 19:15 | 13 |
| 2022.04.21. 19:30 | 13 |
| 2022.04.21. 19:45 | 13 |
| 2022.04.21. 20:00 | 13 |
| 2022.04.21. 20:15 | 13 |
| 2022.04.21. 20:30 | 13 |
| 2022.04.21. 20:45 | 13 |
| 2022.04.21. 21:00 | 13 |
| 2022.04.21. 21:15 | 13 |
| 2022.04.21. 21:30 | 13 |
| 2022.04.21. 21:45 | 13 |
| 2022.04.21. 22:00 | 13 |
| 2022.04.21. 22:15 | 13 |
| 2022.04.21. 22:30 | 13 |
| 2022.04.21. 22:45 | 13 |
| 2022.04.21. 23:00 | 13 |
| 2022.04.21. 23:15 | 13 |
| 2022.04.21. 23:30 | 13 |
| 2022.04.21. 23:45 | 13 |
| 2022.04.22. 00:00 | 13 |
| 2022.04.22. 00:15 | 13 |
| 2022.04.22. 00:30 | 13 |
| 2022.04.22. 00:45 | 13 |
| 2022.04.22. 01:00 | 13 |
| 2022.04.22. 01:15 | 13 |
| 2022.04.22. 01:30 | 13 |
| 2022.04.22. 01:45 | 13 |
| 2022.04.22. 02:00 | 13 |
| 2022.04.22. 02:15 | 13 |
| 2022.04.22. 02:30 | 13 |
| 2022.04.22. 02:45 | 13 |
| 2022.04.22. 03:00 | 13 |
| 2022.04.22. 03:15 | 13 |
| 2022.04.22. 03:30 | 13 |
| 2022.04.22. 03:45 | 13 |
| 2022.04.22. 04:00 | 13 |
| 2022.04.22. 04:15 | 13 |
| 2022.04.22. 04:30 | 13 |
| 2022.04.22. 04:45 | 13 |
| 2022.04.22. 05:00 | 13 |
| 2022.04.22. 05:15 | 13 |
| 2022.04.22. 05:30 | 13 |
| 2022.04.22. 05:45 | 13 |
| 2022.04.22. 06:00 | 13 |
| 2022.04.22. 06:15 | 13 |
| 2022.04.22. 06:30 | 13 |
| 2022.04.22. 06:45 | 13 |
| 2022.04.22. 07:00 | 13 |
| 2022.04.22. 07:15 | 13 |
| 2022.04.22. 07:30 | 13 |
| 2022.04.22. 07:45 | 13 |
| 2022.04.22. 08:00 | 13 |
| 2022.04.22. 08:15 | 13 |
| 2022.04.22. 08:30 | 13 |
| 2022.04.22. 08:45 | 13 |
| 2022.04.22. 09:00 | 13 |
| 2022.04.22. 09:15 | 13 |
| 2022.04.22. 09:30 | 13 |
| 2022.04.22. 09:45 | 13 |
| 2022.04.22. 10:00 | 13 |
| 2022.04.22. 10:15 | 13 |
| 2022.04.22. 10:30 | 13 |
| 2022.04.22. 10:45 | 13 |
| 2022.04.22. 11:00 | 13 |
| 2022.04.22. 11:15 | 13 |
| 2022.04.22. 11:30 | 13 |
| 2022.04.22. 11:45 | 13 |
| 2022.04.22. 12:00 | 13 |
| 2022.04.22. 12:15 | 13 |
| 2022.04.22. 12:30 | 13 |
| 2022.04.22. 12:45 | 13 |
| 2022.04.22. 13:00 | 13 |
| 2022.04.22. 13:15 | 13 |
| 2022.04.22. 13:30 | 13 |
| 2022.04.22. 13:45 | 13 |
| 2022.04.22. 14:00 | 13 |
| 2022.04.22. 14:15 | 13 |
| 2022.04.22. 14:30 | 13 |
| 2022.04.22. 14:45 | 13 |
| 2022.04.22. 15:00 | 13 |
| 2022.04.22. 15:15 | 13 |
| 2022.04.22. 15:30 | 13 |
| 2022.04.22. 15:45 | 13 |
| 2022.04.22. 16:00 | 13 |
| 2022.04.22. 16:15 | 13 |
| 2022.04.22. 16:30 | 13 |
| 2022.04.22. 16:45 | 13 |
| 2022.04.22. 17:00 | 13 |
| 2022.04.22. 17:15 | 13 |
| 2022.04.22. 17:30 | 13 |
| 2022.04.22. 17:45 | 13 |
| 2022.04.22. 18:00 | 13 |
| 2022.04.22. 18:15 | 13 |
| 2022.04.22. 18:30 | 13 |
| 2022.04.22. 18:45 | 13 |
| 2022.04.22. 19:00 | 13 |
| 2022.04.22. 19:15 | 13 |
| 2022.04.22. 19:30 | 13 |
| 2022.04.22. 19:45 | 13 |
| 2022.04.22. 20:00 | 13 |
| 2022.04.22. 20:15 | 13 |
| 2022.04.22. 20:30 | 13 |
| 2022.04.22. 20:45 | 13 |
| 2022.04.22. 21:00 | 13 |
| 2022.04.22. 21:15 | 13 |
| 2022.04.22. 21:30 | 13 |
| 2022.04.22. 21:45 | 13 |
| 2022.04.22. 22:00 | 13 |
| 2022.04.22. 22:15 | 13 |
| 2022.04.22. 22:30 | 13 |
| 2022.04.22. 22:45 | 13 |
| 2022.04.22. 23:00 | 13 |
| 2022.04.22. 23:15 | 13 |
| 2022.04.22. 23:30 | 13 |
| 2022.04.22. 23:45 | 13 |
| 2022.04.23. 00:00 | 13 |
| 2022.04.23. 00:15 | 13 |
| 2022.04.23. 00:30 | 13 |
| 2022.04.23. 00:45 | 13 |
| 2022.04.23. 01:00 | 13 |
| 2022.04.23. 01:15 | 13 |
| 2022.04.23. 01:30 | 13 |
| 2022.04.23. 01:45 | 13 |
| 2022.04.23. 02:00 | 13 |
| 2022.04.23. 02:15 | 13 |
| 2022.04.23. 02:30 | 13 |
| 2022.04.23. 02:45 | 13 |
| 2022.04.23. 03:00 | 13 |
| 2022.04.23. 03:15 | 13 |
| 2022.04.23. 03:30 | 13 |
| 2022.04.23. 03:45 | 13 |
| 2022.04.23. 04:00 | 13 |
| 2022.04.23. 04:15 | 13 |
| 2022.04.23. 04:30 | 13 |
| 2022.04.23. 04:45 | 13 |
| 2022.04.23. 05:00 | 13 |
| 2022.04.23. 05:15 | 13 |
| 2022.04.23. 05:30 | 13 |
| 2022.04.23. 05:45 | 13 |
| 2022.04.23. 06:00 | 13 |
| 2022.04.23. 06:15 | 13 |
| 2022.04.23. 06:30 | 13 |
| 2022.04.23. 06:45 | 13 |
| 2022.04.23. 07:00 | 13 |
| 2022.04.23. 07:15 | 13 |
| 2022.04.23. 07:30 | 13 |
| 2022.04.23. 07:45 | 13 |
| 2022.04.23. 08:00 | 13 |
| 2022.04.23. 08:15 | 13 |
| 2022.04.23. 08:30 | 13 |
| 2022.04.23. 08:45 | 13 |
| 2022.04.23. 09:00 | 13 |
| 2022.04.23. 09:15 | 13 |
| 2022.04.23. 09:30 | 13 |
| 2022.04.23. 09:45 | 13 |
| 2022.04.23. 10:00 | 13 |
| 2022.04.23. 10:15 | 13 |
| 2022.04.23. 10:30 | 13 |
| 2022.04.23. 10:45 | 13 |
| 2022.04.23. 11:00 | 13 |
| 2022.04.23. 11:15 | 13 |
| 2022.04.23. 11:30 | 13 |
| 2022.04.23. 11:45 | 13 |
| 2022.04.23. 12:00 | 13 |
| 2022.04.23. 12:15 | 13 |
| 2022.04.23. 12:30 | 13 |
| 2022.04.23. 12:45 | 13 |
| 2022.04.23. 13:00 | 13 |
| 2022.04.23. 13:15 | 13 |
| 2022.04.23. 13:30 | 13 |
| 2022.04.23. 13:45 | 13 |
| 2022.04.23. 14:00 | 13 |
| 2022.04.23. 14:15 | 13 |
| 2022.04.23. 14:30 | 13 |
| 2022.04.23. 14:45 | 13 |
| 2022.04.23. 15:00 | 13 |
| 2022.04.23. 15:15 | 13 |
| 2022.04.23. 15:30 | 13 |
| 2022.04.23. 15:45 | 13 |
| 2022.04.23. 16:00 | 13 |
| 2022.04.23. 16:15 | 13 |
| 2022.04.23. 16:30 | 13 |
| 2022.04.23. 16:45 | 13 |
| 2022.04.23. 17:00 | 13 |
| 2022.04.23. 17:15 | 13 |
| 2022.04.23. 17:30 | 13 |
| 2022.04.23. 17:45 | 13 |
| 2022.04.23. 18:00 | 13 |
| 2022.04.23. 18:15 | 13 |
| 2022.04.23. 18:30 | 13 |
| 2022.04.23. 18:45 | 13 |
| 2022.04.23. 19:00 | 13 |
| 2022.04.23. 19:15 | 13 |
| 2022.04.23. 19:30 | 13 |
| 2022.04.23. 19:45 | 13 |
| 2022.04.23. 20:00 | 13 |
| 2022.04.23. 20:15 | 13 |
| 2022.04.23. 20:30 | 13 |
| 2022.04.23. 20:45 | 13 |
| 2022.04.23. 21:00 | 13 |
| 2022.04.23. 21:15 | 13 |
| 2022.04.23. 21:30 | 13 |
| 2022.04.23. 21:45 | 13 |
| 2022.04.23. 22:00 | 13 |
| 2022.04.23. 22:15 | 13 |
| 2022.04.23. 22:30 | 13 |
| 2022.04.23. 22:45 | 13 |
| 2022.04.23. 23:00 | 13 |
| 2022.04.23. 23:15 | 13 |
| 2022.04.23. 23:30 | 13 |
| 2022.04.23. 23:45 | 13 |
| 2022.04.24. 00:00 | 13 |
| 2022.04.24. 00:15 | 13 |
| 2022.04.24. 00:30 | 13 |
| 2022.04.24. 00:45 | 13 |
| 2022.04.24. 01:00 | 13 |
| 2022.04.24. 01:15 | 13 |
| 2022.04.24. 01:30 | 13 |
| 2022.04.24. 01:45 | 13 |
| 2022.04.24. 02:00 | 13 |
| 2022.04.24. 02:15 | 13 |
| 2022.04.24. 02:30 | 13 |
| 2022.04.24. 02:45 | 13 |
| 2022.04.24. 03:00 | 13 |
| 2022.04.24. 03:15 | 13 |
| 2022.04.24. 03:30 | 13 |
| 2022.04.24. 03:45 | 13 |
| 2022.04.24. 04:00 | 13 |
| 2022.04.24. 04:15 | 13 |
| 2022.04.24. 04:30 | 13 |
| 2022.04.24. 04:45 | 13 |
| 2022.04.24. 05:00 | 13 |
| 2022.04.24. 05:15 | 13 |
| 2022.04.24. 05:30 | 13 |
| 2022.04.24. 05:45 | 13 |
| 2022.04.24. 06:00 | 13 |
| 2022.04.24. 06:15 | 13 |
| 2022.04.24. 06:30 | 13 |
| 2022.04.24. 06:45 | 13 |
| 2022.04.24. 07:00 | 13 |
| 2022.04.24. 07:15 | 13 |
| 2022.04.24. 07:30 | 13 |
| 2022.04.24. 07:45 | 13 |
| 2022.04.24. 08:00 | 13 |
| 2022.04.24. 08:15 | 13 |
| 2022.04.24. 08:30 | 13 |
| 2022.04.24. 08:45 | 13 |
| 2022.04.24. 09:00 | 13 |
| 2022.04.24. 09:15 | 13 |
| 2022.04.24. 09:30 | 13 |
| 2022.04.24. 09:45 | 13 |
| 2022.04.24. 10:00 | 13 |
| 2022.04.24. 10:15 | 13 |
| 2022.04.24. 10:30 | 13 |
| 2022.04.24. 10:45 | 13 |
| 2022.04.24. 11:00 | 13 |
| 2022.04.24. 11:15 | 13 |
| 2022.04.24. 11:30 | 13 |
| 2022.04.24. 11:45 | 13 |
| 2022.04.24. 12:00 | 13 |
| 2022.04.24. 12:15 | 13 |
| 2022.04.24. 12:30 | 13 |
| 2022.04.24. 12:45 | 13 |
| 2022.04.24. 13:00 | 13 |
| 2022.04.24. 13:15 | 13 |
| 2022.04.24. 13:30 | 13 |
| 2022.04.24. 13:45 | 13 |
| 2022.04.24. 14:00 | 13 |
| 2022.04.24. 14:15 | 13 |
| 2022.04.24. 14:30 | 13 |
| 2022.04.24. 14:45 | 13 |
| 2022.04.24. 15:00 | 13 |
| 2022.04.24. 15:15 | 13 |
| 2022.04.24. 15:30 | 13 |
| 2022.04.24. 15:45 | 13 |
| 2022.04.24. 16:00 | 13 |
| 2022.04.24. 16:15 | 13 |
| 2022.04.24. 16:30 | 13 |
| 2022.04.24. 16:45 | 13 |
| 2022.04.24. 17:00 | 13 |
| 2022.04.24. 17:15 | 13 |
| 2022.04.24. 17:30 | 13 |
| 2022.04.24. 17:45 | 13 |
| 2022.04.24. 18:00 | 13 |
| 2022.04.24. 18:15 | 13 |
| 2022.04.24. 18:30 | 13 |
| 2022.04.24. 18:45 | 13 |
| 2022.04.24. 19:00 | 13 |
| 2022.04.24. 19:15 | 13 |
| 2022.04.24. 19:30 | 13 |
| 2022.04.24. 19:45 | 13 |
| 2022.04.24. 20:00 | 13 |
| 2022.04.24. 20:15 | 13 |
| 2022.04.24. 20:30 | 13 |
| 2022.04.24. 20:45 | 13 |
| 2022.04.24. 21:00 | 13 |
| 2022.04.24. 21:15 | 13 |
| 2022.04.24. 21:30 | 13 |
| 2022.04.24. 21:45 | 13 |
| 2022.04.24. 22:00 | 13 |
| 2022.04.24. 22:15 | 13 |
| 2022.04.24. 22:30 | 13 |
| 2022.04.24. 22:45 | 13 |
| 2022.04.24. 23:00 | 13 |
| 2022.04.24. 23:15 | 13 |
| 2022.04.24. 23:30 | 13 |
| 2022.04.24. 23:45 | 13 |
| 2022.04.25. 00:00 | 13 |
| 2022.04.25. 00:15 | 13 |
| 2022.04.25. 00:30 | 13 |
| 2022.04.25. 00:45 | 13 |
| 2022.04.25. 01:00 | 13 |
| 2022.04.25. 01:15 | 13 |
| 2022.04.25. 01:30 | 13 |
| 2022.04.25. 01:45 | 13 |
| 2022.04.25. 02:00 | 13 |
| 2022.04.25. 02:15 | 13 |
| 2022.04.25. 02:30 | 13 |
| 2022.04.25. 02:45 | 13 |
| 2022.04.25. 03:00 | 13 |
| 2022.04.25. 03:15 | 13 |
| 2022.04.25. 03:30 | 13 |
| 2022.04.25. 03:45 | 13 |
| 2022.04.25. 04:00 | 13 |
| 2022.04.25. 04:15 | 13 |
| 2022.04.25. 04:30 | 13 |
| 2022.04.25. 04:45 | 13 |
| 2022.04.25. 05:00 | 13 |
| 2022.04.25. 05:15 | 13 |
| 2022.04.25. 05:30 | 13 |
| 2022.04.25. 05:45 | 13 |
| 2022.04.25. 06:00 | 13 |
| 2022.04.25. 06:15 | 13 |
| 2022.04.25. 06:30 | 13 |
| 2022.04.25. 06:45 | 13 |
| 2022.04.25. 07:00 | 13 |
| 2022.04.25. 07:15 | 13 |
| 2022.04.25. 07:30 | 13 |
| 2022.04.25. 07:45 | 13 |
| 2022.04.25. 08:00 | 13 |
| 2022.04.25. 08:15 | 13 |
| 2022.04.25. 08:30 | 13 |
| 2022.04.25. 08:45 | 13 |
| 2022.04.25. 09:00 | 13 |
| 2022.04.25. 09:15 | 13 |
| 2022.04.25. 09:30 | 13 |
| 2022.04.25. 09:45 | 13 |
| 2022.04.25. 10:00 | 13 |
| 2022.04.25. 10:15 | 13 |
| 2022.04.25. 10:30 | 13 |
| 2022.04.25. 10:45 | 13 |
| 2022.04.25. 11:00 | 13 |
| 2022.04.25. 11:15 | 13 |
| 2022.04.25. 11:30 | 13 |
| 2022.04.25. 11:45 | 13 |
| 2022.04.25. 12:00 | 13 |
| 2022.04.25. 12:15 | 13 |
| 2022.04.25. 12:30 | 13 |
| 2022.04.25. 12:45 | 13 |
| 2022.04.25. 13:00 | 13 |
| 2022.04.25. 13:15 | 13 |
| 2022.04.25. 13:30 | 13 |
| 2022.04.25. 13:45 | 13 |
| 2022.04.25. 14:00 | 13 |
| 2022.04.25. 14:15 | 13 |
| 2022.04.25. 14:30 | 13 |
| 2022.04.25. 14:45 | 13 |
| 2022.04.25. 15:00 | 13 |
| 2022.04.25. 15:15 | 13 |
| 2022.04.25. 15:30 | 13 |
| 2022.04.25. 15:45 | 13 |
| 2022.04.25. 16:00 | 13 |
| 2022.04.25. 16:15 | 13 |
| 2022.04.25. 16:30 | 13 |
| 2022.04.25. 16:45 | 13 |
| 2022.04.25. 17:00 | 13 |
| 2022.04.25. 17:15 | 13 |
| 2022.04.25. 17:30 | 13 |
| 2022.04.25. 17:45 | 13 |
| 2022.04.25. 18:00 | 13 |
| 2022.04.25. 18:15 | 13 |
| 2022.04.25. 18:30 | 13 |
| 2022.04.25. 18:45 | 13 |
| 2022.04.25. 19:00 | 13 |
| 2022.04.25. 19:15 | 13 |
| 2022.04.25. 19:30 | 13 |
| 2022.04.25. 19:45 | 13 |
| 2022.04.25. 20:00 | 13 |
| 2022.04.25. 20:15 | 13 |
| 2022.04.25. 20:30 | 13 |
| 2022.04.25. 20:45 | 13 |
| 2022.04.25. 21:00 | 13 |
| 2022.04.25. 21:15 | 13 |
| 2022.04.25. 21:30 | 13 |
| 2022.04.25. 21:45 | 13 |
| 2022.04.25. 22:00 | 13 |
| 2022.04.25. 22:15 | 13 |
| 2022.04.25. 22:30 | 13 |
| 2022.04.25. 22:45 | 13 |
| 2022.04.25. 23:00 | 13 |
| 2022.04.25. 23:15 | 13 |
| 2022.04.25. 23:30 | 13 |
| 2022.04.25. 23:45 | 13 |
| 2022.04.26. 00:00 | 13 |
| 2022.04.26. 00:15 | 13 |
| 2022.04.26. 00:30 | 13 |
| 2022.04.26. 00:45 | 13 |
| 2022.04.26. 01:00 | 13 |
| 2022.04.26. 01:15 | 13 |
| 2022.04.26. 01:30 | 13 |
| 2022.04.26. 01:45 | 13 |
| 2022.04.26. 02:00 | 13 |
| 2022.04.26. 02:15 | 13 |
| 2022.04.26. 02:30 | 13 |
| 2022.04.26. 02:45 | 13 |
| 2022.04.26. 03:00 | 13 |
| 2022.04.26. 03:15 | 13 |
| 2022.04.26. 03:30 | 13 |
| 2022.04.26. 03:45 | 13 |
| 2022.04.26. 04:00 | 13 |
| 2022.04.26. 04:15 | 13 |
| 2022.04.26. 04:30 | 13 |
| 2022.04.26. 04:45 | 13 |
| 2022.04.26. 05:00 | 13 |
| 2022.04.26. 05:15 | 13 |
| 2022.04.26. 05:30 | 13 |
| 2022.04.26. 05:45 | 13 |
| 2022.04.26. 06:00 | 13 |
| 2022.04.26. 06:15 | 13 |
| 2022.04.26. 06:30 | 13 |
| 2022.04.26. 06:45 | 13 |
| 2022.04.26. 07:00 | 13 |
| 2022.04.26. 07:15 | 13 |
| 2022.04.26. 07:30 | 13 |
| 2022.04.26. 07:45 | 13 |
| 2022.04.26. 08:00 | 13 |
| 2022.04.26. 08:15 | 13 |
| 2022.04.26. 08:30 | 13 |
| 2022.04.26. 08:45 | 13 |
| 2022.04.26. 09:00 | 13 |
| 2022.04.26. 09:15 | 13 |
| 2022.04.26. 09:30 | 13 |
| 2022.04.26. 09:45 | 13 |
| 2022.04.26. 10:00 | 13 |
| 2022.04.26. 10:15 | 13 |
| 2022.04.26. 10:30 | 13 |
| 2022.04.26. 10:45 | 13 |
| 2022.04.26. 11:00 | 13 |
| 2022.04.26. 11:15 | 13 |
| 2022.04.26. 11:30 | 13 |
| 2022.04.26. 11:45 | 13 |
| 2022.04.26. 12:00 | 13 |
| 2022.04.26. 12:15 | 13 |
| 2022.04.26. 12:30 | 13 |
| 2022.04.26. 12:45 | 13 |
| 2022.04.26. 13:00 | 13 |
| 2022.04.26. 13:15 | 13 |
| 2022.04.26. 13:30 | 13 |
| 2022.04.26. 13:45 | 13 |
| 2022.04.26. 14:00 | 13 |
| 2022.04.26. 14:15 | 13 |
| 2022.04.26. 14:30 | 13 |
| 2022.04.26. 14:45 | 13 |
| 2022.04.26. 15:00 | 13 |
| 2022.04.26. 15:15 | 13 |
| 2022.04.26. 15:30 | 13 |
| 2022.04.26. 15:45 | 13 |
| 2022.04.26. 16:00 | 13 |
| 2022.04.26. 16:15 | 13 |
| 2022.04.26. 16:30 | 13 |
| 2022.04.26. 16:45 | 13 |
| 2022.04.26. 17:00 | 13 |
| 2022.04.26. 17:15 | 13 |
| 2022.04.26. 17:30 | 13 |
| 2022.04.26. 17:45 | 13 |
| 2022.04.26. 18:00 | 13 |
| 2022.04.26. 18:15 | 13 |
| 2022.04.26. 18:30 | 13 |
| 2022.04.26. 18:45 | 13 |
| 2022.04.26. 19:00 | 13 |
| 2022.04.26. 19:15 | 13 |
| 2022.04.26. 19:30 | 13 |
| 2022.04.26. 19:45 | 13 |
| 2022.04.26. 20:00 | 13 |
| 2022.04.26. 20:15 | 13 |
| 2022.04.26. 20:30 | 13 |
| 2022.04.26. 20:45 | 13 |
| 2022.04.26. 21:00 | 13 |
| 2022.04.26. 21:15 | 13 |
| 2022.04.26. 21:30 | 13 |
| 2022.04.26. 21:45 | 13 |
| 2022.04.26. 22:00 | 13 |
| 2022.04.26. 22:15 | 13 |
| 2022.04.26. 22:30 | 13 |
| 2022.04.26. 22:45 | 13 |
| 2022.04.26. 23:00 | 13 |
| 2022.04.26. 23:15 | 13 |
| 2022.04.26. 23:30 | 13 |
| 2022.04.26. 23:45 | 13 |
| 2022.04.27. 00:00 | 13 |
| 2022.04.27. 00:15 | 13 |
| 2022.04.27. 00:30 | 13 |
| 2022.04.27. 00:45 | 13 |
| 2022.04.27. 01:00 | 13 |
| 2022.04.27. 01:15 | 13 |
| 2022.04.27. 01:30 | 13 |
| 2022.04.27. 01:45 | 13 |
| 2022.04.27. 02:00 | 13 |
| 2022.04.27. 02:15 | 13 |
| 2022.04.27. 02:30 | 13 |
| 2022.04.27. 02:45 | 13 |
| 2022.04.27. 03:00 | 13 |
| 2022.04.27. 03:15 | 13 |
| 2022.04.27. 03:30 | 13 |
| 2022.04.27. 03:45 | 13 |
| 2022.04.27. 04:00 | 13 |
| 2022.04.27. 04:15 | 13 |
| 2022.04.27. 04:30 | 13 |
| 2022.04.27. 04:45 | 13 |
| 2022.04.27. 05:00 | 13 |
| 2022.04.27. 05:15 | 13 |
| 2022.04.27. 05:30 | 13 |
| 2022.04.27. 05:45 | 13 |
| 2022.04.27. 06:00 | 13 |
| 2022.04.27. 06:15 | 13 |
| 2022.04.27. 06:30 | 13 |
| 2022.04.27. 06:45 | 13 |
| 2022.04.27. 07:00 | 13 |
| 2022.04.27. 07:15 | 13 |
| 2022.04.27. 07:30 | 13 |
| 2022.04.27. 07:45 | 13 |
| 2022.04.27. 08:00 | 13 |
| 2022.04.27. 08:15 | 13 |
| 2022.04.27. 08:30 | 13 |
| 2022.04.27. 08:45 | 13 |
| 2022.04.27. 09:00 | 13 |
| 2022.04.27. 09:15 | 13 |
| 2022.04.27. 09:30 | 13 |
| 2022.04.27. 09:45 | 13 |
| 2022.04.27. 10:00 | 13 |
| 2022.04.27. 10:15 | 13 |
| 2022.04.27. 10:30 | 13 |
| 2022.04.27. 10:45 | 13 |
| 2022.04.27. 11:00 | 13 |
| 2022.04.27. 11:15 | 13 |
| 2022.04.27. 11:30 | 13 |
| 2022.04.27. 11:45 | 13 |
| 2022.04.27. 12:00 | 13 |
| 2022.04.27. 12:15 | 13 |
| 2022.04.27. 12:30 | 13 |
| 2022.04.27. 12:45 | 13 |
| 2022.04.27. 13:00 | 13 |
| 2022.04.27. 13:15 | 13 |
| 2022.04.27. 13:30 | 13 |
| 2022.04.27. 13:45 | 13 |
| 2022.04.27. 14:00 | 13 |
| 2022.04.27. 14:15 | 13 |
| 2022.04.27. 14:30 | 13 |
| 2022.04.27. 14:45 | 13 |
| 2022.04.27. 15:00 | 13 |
| 2022.04.27. 15:15 | 13 |
| 2022.04.27. 15:30 | 13 |
| 2022.04.27. 15:45 | 13 |
| 2022.04.27. 16:00 | 13 |
| 2022.04.27. 16:15 | 13 |
| 2022.04.27. 16:30 | 13 |
| 2022.04.27. 16:45 | 13 |
| 2022.04.27. 17:00 | 13 |
| 2022.04.27. 17:15 | 13 |
| 2022.04.27. 17:30 | 13 |
| 2022.04.27. 17:45 | 13 |
| 2022.04.27. 18:00 | 13 |
| 2022.04.27. 18:15 | 13 |
| 2022.04.27. 18:30 | 13 |
| 2022.04.27. 18:45 | 13 |
| 2022.04.27. 19:00 | 13 |
| 2022.04.27. 19:15 | 13 |
| 2022.04.27. 19:30 | 13 |
| 2022.04.27. 19:45 | 13 |
| 2022.04.27. 20:00 | 13 |
| 2022.04.27. 20:15 | 13 |
| 2022.04.27. 20:30 | 13 |
| 2022.04.27. 20:45 | 13 |
| 2022.04.27. 21:00 | 13 |
| 2022.04.27. 21:15 | 13 |
| 2022.04.27. 21:30 | 13 |
| 2022.04.27. 21:45 | 13 |
| 2022.04.27. 22:00 | 13 |
| 2022.04.27. 22:15 | 13 |
| 2022.04.27. 22:30 | 13 |
| 2022.04.27. 22:45 | 13 |
| 2022.04.27. 23:00 | 13 |
| 2022.04.27. 23:15 | 13 |
| 2022.04.27. 23:30 | 13 |
| 2022.04.27. 23:45 | 13 |
| 2022.04.28. 00:00 | 13 |
| 2022.04.28. 00:15 | 13 |
| 2022.04.28. 00:30 | 13 |
| 2022.04.28. 00:45 | 13 |
| 2022.04.28. 01:00 | 13 |
| 2022.04.28. 01:15 | 13 |
| 2022.04.28. 01:30 | 13 |
| 2022.04.28. 01:45 | 13 |
| 2022.04.28. 02:00 | 13 |
| 2022.04.28. 02:15 | 13 |
| 2022.04.28. 02:30 | 13 |
| 2022.04.28. 02:45 | 13 |
| 2022.04.28. 03:00 | 13 |
| 2022.04.28. 03:15 | 13 |
| 2022.04.28. 03:30 | 13 |
| 2022.04.28. 03:45 | 13 |
| 2022.04.28. 04:00 | 13 |
| 2022.04.28. 04:15 | 13 |
| 2022.04.28. 04:30 | 13 |
| 2022.04.28. 04:45 | 13 |
| 2022.04.28. 05:00 | 13 |
| 2022.04.28. 05:15 | 13 |
| 2022.04.28. 05:30 | 13 |
| 2022.04.28. 05:45 | 13 |
| 2022.04.28. 06:00 | 13 |
| 2022.04.28. 06:15 | 13 |
| 2022.04.28. 06:30 | 13 |
| 2022.04.28. 06:45 | 13 |
| 2022.04.28. 07:00 | 13 |
| 2022.04.28. 07:15 | 13 |
| 2022.04.28. 07:30 | 13 |
| 2022.04.28. 07:45 | 13 |
| 2022.04.28. 08:00 | 13 |
| 2022.04.28. 08:15 | 13 |
| 2022.04.28. 08:30 | 13 |
| 2022.04.28. 08:45 | 13 |
| 2022.04.28. 09:00 | 13 |
| 2022.04.28. 09:15 | 13 |
| 2022.04.28. 09:30 | 13 |
| 2022.04.28. 09:45 | 13 |
| 2022.04.28. 10:00 | 13 |
| 2022.04.28. 10:15 | 13 |
| 2022.04.28. 10:30 | 13 |
| 2022.04.28. 10:45 | 13 |
| 2022.04.28. 11:00 | 13 |
| 2022.04.28. 11:15 | 13 |
| 2022.04.28. 11:30 | 13 |
| 2022.04.28. 11:45 | 13 |
| 2022.04.28. 12:00 | 13 |
| 2022.04.28. 12:15 | 13 |
| 2022.04.28. 12:30 | 13 |
| 2022.04.28. 12:45 | 13 |
| 2022.04.28. 13:00 | 13 |
| 2022.04.28. 13:15 | 13 |
| 2022.04.28. 13:30 | 13 |
| 2022.04.28. 13:45 | 13 |
| 2022.04.28. 14:00 | 13 |
| 2022.04.28. 14:15 | 13 |
| 2022.04.28. 14:30 | 13 |
| 2022.04.28. 14:45 | 13 |
| 2022.04.28. 15:00 | 13 |
| 2022.04.28. 15:15 | 13 |
| 2022.04.28. 15:30 | 13 |
| 2022.04.28. 15:45 | 13 |
| 2022.04.28. 16:00 | 13 |
| 2022.04.28. 16:15 | 13 |
| 2022.04.28. 16:30 | 13 |
| 2022.04.28. 16:45 | 13 |
| 2022.04.28. 17:00 | 13 |
| 2022.04.28. 17:15 | 13 |
| 2022.04.28. 17:30 | 13 |
| 2022.04.28. 17:45 | 13 |
| 2022.04.28. 18:00 | 13 |
| 2022.04.28. 18:15 | 13 |
| 2022.04.28. 18:30 | 13 |
| 2022.04.28. 18:45 | 13 |
| 2022.04.28. 19:00 | 13 |
| 2022.04.28. 19:15 | 13 |
| 2022.04.28. 19:30 | 13 |
| 2022.04.28. 19:45 | 13 |
| 2022.04.28. 20:00 | 13 |
| 2022.04.28. 20:15 | 13 |
| 2022.04.28. 20:30 | 13 |
| 2022.04.28. 20:45 | 13 |
| 2022.04.28. 21:00 | 13 |
| 2022.04.28. 21:15 | 13 |
| 2022.04.28. 21:30 | 13 |
| 2022.04.28. 21:45 | 13 |
| 2022.04.28. 22:00 | 13 |
| 2022.04.28. 22:15 | 13 |
| 2022.04.28. 22:30 | 13 |
| 2022.04.28. 22:45 | 13 |
| 2022.04.28. 23:00 | 13 |
| 2022.04.28. 23:15 | 13 |
| 2022.04.28. 23:30 | 13 |
| 2022.04.28. 23:45 | 13 |
| 2022.04.29. 00:00 | 13 |
| 2022.04.29. 00:15 | 0 |
| 2022.04.29. 00:30 | 0 |
| 2022.04.29. 00:45 | 0 |
| 2022.04.29. 01:00 | 0 |
| 2022.04.29. 01:15 | 0 |
| 2022.04.29. 01:30 | 0 |
| 2022.04.29. 01:45 | 0 |
| 2022.04.29. 02:00 | 0 |
| 2022.04.29. 02:15 | 0 |
| 2022.04.29. 02:30 | 0 |
| 2022.04.29. 02:45 | 0 |
| 2022.04.29. 03:00 | 0 |
| 2022.04.29. 03:15 | 0 |
| 2022.04.29. 03:30 | 0 |
| 2022.04.29. 03:45 | 0 |
| 2022.04.29. 04:00 | 0 |
| 2022.04.29. 04:15 | 0 |
| 2022.04.29. 04:30 | 0 |
| 2022.04.29. 04:45 | 0 |
| 2022.04.29. 05:00 | 0 |
| 2022.04.29. 05:15 | 0 |
| 2022.04.29. 05:30 | 0 |
| 2022.04.29. 05:45 | 0 |
| 2022.04.29. 06:00 | 0 |
| 2022.04.29. 06:15 | 0 |
| 2022.04.29. 06:30 | 0 |
| 2022.04.29. 06:45 | 0 |
| 2022.04.29. 07:00 | 0 |
| 2022.04.29. 07:15 | 0 |
| 2022.04.29. 07:30 | 0 |
| 2022.04.29. 07:45 | 0 |
| 2022.04.29. 08:00 | 0 |
| 2022.04.29. 08:15 | 0 |
| 2022.04.29. 08:30 | 0 |
| 2022.04.29. 08:45 | 0 |
| 2022.04.29. 09:00 | 0 |
| 2022.04.29. 09:15 | 0 |
| 2022.04.29. 09:30 | 0 |
| 2022.04.29. 09:45 | 0 |
| 2022.04.29. 10:00 | 0 |
| 2022.04.29. 10:15 | 0 |
| 2022.04.29. 10:30 | 0 |
| 2022.04.29. 10:45 | 0 |
| 2022.04.29. 11:00 | 0 |
| 2022.04.29. 11:15 | 0 |
| 2022.04.29. 11:30 | 0 |
| 2022.04.29. 11:45 | 0 |
| 2022.04.29. 12:00 | 0 |
| 2022.04.29. 12:15 | 0 |
| 2022.04.29. 12:30 | 0 |
| 2022.04.29. 12:45 | 0 |
| 2022.04.29. 13:00 | 0 |
| 2022.04.29. 13:15 | 0 |
| 2022.04.29. 13:30 | 0 |
| 2022.04.29. 13:45 | 0 |
| 2022.04.29. 14:00 | 0 |
| 2022.04.29. 14:15 | 0 |
| 2022.04.29. 14:30 | 0 |
| 2022.04.29. 14:45 | 0 |
| 2022.04.29. 15:00 | 0 |
| 2022.04.29. 15:15 | 0 |
| 2022.04.29. 15:30 | 0 |
| 2022.04.29. 15:45 | 0 |
| 2022.04.29. 16:00 | 0 |
| 2022.04.29. 16:15 | 0 |
| 2022.04.29. 16:30 | 0 |
| 2022.04.29. 16:45 | 0 |
| 2022.04.29. 17:00 | 0 |
| 2022.04.29. 17:15 | 0 |
| 2022.04.29. 17:30 | 0 |
| 2022.04.29. 17:45 | 0 |
| 2022.04.29. 18:00 | 0 |
| 2022.04.29. 18:15 | 0 |
| 2022.04.29. 18:30 | 0 |
| 2022.04.29. 18:45 | 0 |
| 2022.04.29. 19:00 | 0 |
| 2022.04.29. 19:15 | 0 |
| 2022.04.29. 19:30 | 0 |
| 2022.04.29. 19:45 | 0 |
| 2022.04.29. 20:00 | 0 |
| 2022.04.29. 20:15 | 0 |
| 2022.04.29. 20:30 | 0 |
| 2022.04.29. 20:45 | 0 |
| 2022.04.29. 21:00 | 0 |
| 2022.04.29. 21:15 | 0 |
| 2022.04.29. 21:30 | 0 |
| 2022.04.29. 21:45 | 0 |
| 2022.04.29. 22:00 | 0 |
| 2022.04.29. 22:15 | 0 |
| 2022.04.29. 22:30 | 0 |
| 2022.04.29. 22:45 | 0 |
| 2022.04.29. 23:00 | 0 |
| 2022.04.29. 23:15 | 0 |
| 2022.04.29. 23:30 | 0 |
| 2022.04.29. 23:45 | 0 |
| 2022.04.30. 00:00 | 0 |
| 2022.04.30. 00:15 | 0 |
| 2022.04.30. 00:30 | 0 |
| 2022.04.30. 00:45 | 0 |
| 2022.04.30. 01:00 | 0 |
| 2022.04.30. 01:15 | 0 |
| 2022.04.30. 01:30 | 0 |
| 2022.04.30. 01:45 | 0 |
| 2022.04.30. 02:00 | 0 |
| 2022.04.30. 02:15 | 0 |
| 2022.04.30. 02:30 | 0 |
| 2022.04.30. 02:45 | 0 |
| 2022.04.30. 03:00 | 0 |
| 2022.04.30. 03:15 | 0 |
| 2022.04.30. 03:30 | 0 |
| 2022.04.30. 03:45 | 0 |
| 2022.04.30. 04:00 | 0 |
| 2022.04.30. 04:15 | 0 |
| 2022.04.30. 04:30 | 0 |
| 2022.04.30. 04:45 | 0 |
| 2022.04.30. 05:00 | 0 |
| 2022.04.30. 05:15 | 0 |
| 2022.04.30. 05:30 | 0 |
| 2022.04.30. 05:45 | 0 |
| 2022.04.30. 06:00 | 0 |
| 2022.04.30. 06:15 | 0 |
| 2022.04.30. 06:30 | 0 |
| 2022.04.30. 06:45 | 0 |
| 2022.04.30. 07:00 | 0 |
| 2022.04.30. 07:15 | 0 |
| 2022.04.30. 07:30 | 0 |
| 2022.04.30. 07:45 | 0 |
| 2022.04.30. 08:00 | 0 |
| 2022.04.30. 08:15 | 0 |
| 2022.04.30. 08:30 | 0 |
| 2022.04.30. 08:45 | 0 |
| 2022.04.30. 09:00 | 0 |
| 2022.04.30. 09:15 | 0 |
| 2022.04.30. 09:30 | 0 |
| 2022.04.30. 09:45 | 0 |
| 2022.04.30. 10:00 | 0 |
| 2022.04.30. 10:15 | 0 |
| 2022.04.30. 10:30 | 0 |
| 2022.04.30. 10:45 | 0 |
| 2022.04.30. 11:00 | 0 |
| 2022.04.30. 11:15 | 0 |
| 2022.04.30. 11:30 | 0 |
| 2022.04.30. 11:45 | 0 |
| 2022.04.30. 12:00 | 0 |
| 2022.04.30. 12:15 | 0 |
| 2022.04.30. 12:30 | 0 |
| 2022.04.30. 12:45 | 0 |
| 2022.04.30. 13:00 | 0 |
| 2022.04.30. 13:15 | 0 |
| 2022.04.30. 13:30 | 0 |
| 2022.04.30. 13:45 | 0 |
| 2022.04.30. 14:00 | 0 |
| 2022.04.30. 14:15 | 0 |
| 2022.04.30. 14:30 | 0 |
| 2022.04.30. 14:45 | 0 |
| 2022.04.30. 15:00 | 0 |
| 2022.04.30. 15:15 | 0 |
| 2022.04.30. 15:30 | 0 |
| 2022.04.30. 15:45 | 0 |
| 2022.04.30. 16:00 | 0 |
| 2022.04.30. 16:15 | 0 |
| 2022.04.30. 16:30 | 0 |
| 2022.04.30. 16:45 | 0 |
| 2022.04.30. 17:00 | 0 |
| 2022.04.30. 17:15 | 0 |
| 2022.04.30. 17:30 | 0 |
| 2022.04.30. 17:45 | 0 |
| 2022.04.30. 18:00 | 0 |
| 2022.04.30. 18:15 | 0 |
| 2022.04.30. 18:30 | 0 |
| 2022.04.30. 18:45 | 0 |
| 2022.04.30. 19:00 | 0 |
| 2022.04.30. 19:15 | 0 |
| 2022.04.30. 19:30 | 0 |
| 2022.04.30. 19:45 | 0 |
| 2022.04.30. 20:00 | 0 |
| 2022.04.30. 20:15 | 0 |
| 2022.04.30. 20:30 | 0 |
| 2022.04.30. 20:45 | 0 |
| 2022.04.30. 21:00 | 0 |
| 2022.04.30. 21:15 | 0 |
| 2022.04.30. 21:30 | 0 |
| 2022.04.30. 21:45 | 0 |
| 2022.04.30. 22:00 | 0 |
| 2022.04.30. 22:15 | 0 |
| 2022.04.30. 22:30 | 0 |
| 2022.04.30. 22:45 | 0 |
| 2022.04.30. 23:00 | 0 |
| 2022.04.30. 23:15 | 0 |
| 2022.04.30. 23:30 | 0 |
| 2022.04.30. 23:45 | 0 |
| 2022.05.01. 00:00 | 0 |
| 2022.05.01. 00:15 | 0 |
| 2022.05.01. 00:30 | 0 |
| 2022.05.01. 00:45 | 0 |
| 2022.05.01. 01:00 | 0 |
| 2022.05.01. 01:15 | 0 |
| 2022.05.01. 01:30 | 0 |
| 2022.05.01. 01:45 | 0 |
| 2022.05.01. 02:00 | 0 |
| 2022.05.01. 02:15 | 0 |
| 2022.05.01. 02:30 | 0 |
| 2022.05.01. 02:45 | 0 |
| 2022.05.01. 03:00 | 0 |
| 2022.05.01. 03:15 | 0 |
| 2022.05.01. 03:30 | 0 |
| 2022.05.01. 03:45 | 0 |
| 2022.05.01. 04:00 | 0 |
| 2022.05.01. 04:15 | 0 |
| 2022.05.01. 04:30 | 0 |
| 2022.05.01. 04:45 | 0 |
| 2022.05.01. 05:00 | 0 |
| 2022.05.01. 05:15 | 0 |
| 2022.05.01. 05:30 | 0 |
| 2022.05.01. 05:45 | 0 |
| 2022.05.01. 06:00 | 0 |
| 2022.05.01. 06:15 | 0 |
| 2022.05.01. 06:30 | 0 |
| 2022.05.01. 06:45 | 0 |
| 2022.05.01. 07:00 | 0 |
| 2022.05.01. 07:15 | 0 |
| 2022.05.01. 07:30 | 0 |
| 2022.05.01. 07:45 | 0 |
| 2022.05.01. 08:00 | 0 |
| 2022.05.01. 08:15 | 0 |
| 2022.05.01. 08:30 | 0 |
| 2022.05.01. 08:45 | 0 |
| 2022.05.01. 09:00 | 0 |
| 2022.05.01. 09:15 | 0 |
| 2022.05.01. 09:30 | 0 |
| 2022.05.01. 09:45 | 0 |
| 2022.05.01. 10:00 | 0 |
| 2022.05.01. 10:15 | 0 |
| 2022.05.01. 10:30 | 0 |
| 2022.05.01. 10:45 | 0 |
| 2022.05.01. 11:00 | 0 |
| 2022.05.01. 11:15 | 0 |
| 2022.05.01. 11:30 | 0 |
| 2022.05.01. 11:45 | 0 |
| 2022.05.01. 12:00 | 0 |
| 2022.05.01. 12:15 | 0 |
| 2022.05.01. 12:30 | 0 |
| 2022.05.01. 12:45 | 0 |
| 2022.05.01. 13:00 | 0 |
| 2022.05.01. 13:15 | 0 |
| 2022.05.01. 13:30 | 0 |
| 2022.05.01. 13:45 | 0 |
| 2022.05.01. 14:00 | 0 |
| 2022.05.01. 14:15 | 0 |
| 2022.05.01. 14:30 | 0 |
| 2022.05.01. 14:45 | 0 |
| 2022.05.01. 15:00 | 0 |
| 2022.05.01. 15:15 | 0 |
| 2022.05.01. 15:30 | 0 |
| 2022.05.01. 15:45 | 0 |
| 2022.05.01. 16:00 | 0 |
| 2022.05.01. 16:15 | 0 |
| 2022.05.01. 16:30 | 0 |
| 2022.05.01. 16:45 | 0 |
| 2022.05.01. 17:00 | 0 |
| 2022.05.01. 17:15 | 0 |
| 2022.05.01. 17:30 | 0 |
| 2022.05.01. 17:45 | 0 |
| 2022.05.01. 18:00 | 0 |
| 2022.05.01. 18:15 | 0 |
| 2022.05.01. 18:30 | 0 |
| 2022.05.01. 18:45 | 0 |
| 2022.05.01. 19:00 | 0 |
| 2022.05.01. 19:15 | 0 |
| 2022.05.01. 19:30 | 0 |
| 2022.05.01. 19:45 | 0 |
| 2022.05.01. 20:00 | 0 |
| 2022.05.01. 20:15 | 0 |
| 2022.05.01. 20:30 | 0 |
| 2022.05.01. 20:45 | 0 |
| 2022.05.01. 21:00 | 0 |
| 2022.05.01. 21:15 | 0 |
| 2022.05.01. 21:30 | 0 |
| 2022.05.01. 21:45 | 0 |
| 2022.05.01. 22:00 | 0 |
| 2022.05.01. 22:15 | 0 |
| 2022.05.01. 22:30 | 0 |
| 2022.05.01. 22:45 | 0 |
| 2022.05.01. 23:00 | 0 |
| 2022.05.01. 23:15 | 0 |
| 2022.05.01. 23:30 | 0 |
| 2022.05.01. 23:45 | 0 |
| 2022.05.02. 00:00 | 0 |
| 2022.05.02. 00:15 | 0 |
| 2022.05.02. 00:30 | 0 |
| 2022.05.02. 00:45 | 0 |
| 2022.05.02. 01:00 | 0 |
| 2022.05.02. 01:15 | 0 |
| 2022.05.02. 01:30 | 0 |
| 2022.05.02. 01:45 | 0 |
| 2022.05.02. 02:00 | 0 |
| 2022.05.02. 02:15 | 0 |
| 2022.05.02. 02:30 | 0 |
| 2022.05.02. 02:45 | 0 |
| 2022.05.02. 03:00 | 0 |
| 2022.05.02. 03:15 | 0 |
| 2022.05.02. 03:30 | 0 |
| 2022.05.02. 03:45 | 0 |
| 2022.05.02. 04:00 | 0 |
| 2022.05.02. 04:15 | 0 |
| 2022.05.02. 04:30 | 0 |
| 2022.05.02. 04:45 | 0 |
| 2022.05.02. 05:00 | 0 |
| 2022.05.02. 05:15 | 0 |
| 2022.05.02. 05:30 | 0 |
| 2022.05.02. 05:45 | 0 |
| 2022.05.02. 06:00 | 0 |
| 2022.05.02. 06:15 | 0 |
| 2022.05.02. 06:30 | 0 |
| 2022.05.02. 06:45 | 0 |
| 2022.05.02. 07:00 | 0 |
| 2022.05.02. 07:15 | 0 |
| 2022.05.02. 07:30 | 0 |
| 2022.05.02. 07:45 | 0 |
| 2022.05.02. 08:00 | 0 |
| 2022.05.02. 08:15 | 0 |
| 2022.05.02. 08:30 | 0 |
| 2022.05.02. 08:45 | 0 |
| 2022.05.02. 09:00 | 0 |
| 2022.05.02. 09:15 | 0 |
| 2022.05.02. 09:30 | 0 |
| 2022.05.02. 09:45 | 0 |
| 2022.05.02. 10:00 | 0 |
| 2022.05.02. 10:15 | 0 |
| 2022.05.02. 10:30 | 0 |
| 2022.05.02. 10:45 | 0 |
| 2022.05.02. 11:00 | 0 |
| 2022.05.02. 11:15 | 0 |
| 2022.05.02. 11:30 | 0 |
| 2022.05.02. 11:45 | 0 |
| 2022.05.02. 12:00 | 0 |
| 2022.05.02. 12:15 | 0 |
| 2022.05.02. 12:30 | 0 |
| 2022.05.02. 12:45 | 0 |
| 2022.05.02. 13:00 | 0 |
| 2022.05.02. 13:15 | 0 |
| 2022.05.02. 13:30 | 0 |
| 2022.05.02. 13:45 | 0 |
| 2022.05.02. 14:00 | 0 |
| 2022.05.02. 14:15 | 0 |
| 2022.05.02. 14:30 | 0 |
| 2022.05.02. 14:45 | 0 |
| 2022.05.02. 15:00 | 0 |
| 2022.05.02. 15:15 | 0 |
| 2022.05.02. 15:30 | 0 |
| 2022.05.02. 15:45 | 0 |
| 2022.05.02. 16:00 | 0 |
| 2022.05.02. 16:15 | 0 |
| 2022.05.02. 16:30 | 0 |
| 2022.05.02. 16:45 | 0 |
| 2022.05.02. 17:00 | 0 |
| 2022.05.02. 17:15 | 0 |
| 2022.05.02. 17:30 | 0 |
| 2022.05.02. 17:45 | 0 |
| 2022.05.02. 18:00 | 0 |
| 2022.05.02. 18:15 | 0 |
| 2022.05.02. 18:30 | 0 |
| 2022.05.02. 18:45 | 0 |
| 2022.05.02. 19:00 | 0 |
| 2022.05.02. 19:15 | 0 |
| 2022.05.02. 19:30 | 0 |
| 2022.05.02. 19:45 | 0 |
| 2022.05.02. 20:00 | 0 |
| 2022.05.02. 20:15 | 0 |
| 2022.05.02. 20:30 | 0 |
| 2022.05.02. 20:45 | 0 |
| 2022.05.02. 21:00 | 0 |
| 2022.05.02. 21:15 | 0 |
| 2022.05.02. 21:30 | 0 |
| 2022.05.02. 21:45 | 0 |
| 2022.05.02. 22:00 | 0 |
| 2022.05.02. 22:15 | 0 |
| 2022.05.02. 22:30 | 0 |
| 2022.05.02. 22:45 | 0 |
| 2022.05.02. 23:00 | 0 |
| 2022.05.02. 23:15 | 0 |
| 2022.05.02. 23:30 | 0 |
| 2022.05.02. 23:45 | 0 |
| 2022.05.03. 00:00 | 0 |
| 2022.05.03. 00:15 | 0 |
| 2022.05.03. 00:30 | 0 |
| 2022.05.03. 00:45 | 0 |
| 2022.05.03. 01:00 | 0 |
| 2022.05.03. 01:15 | 0 |
| 2022.05.03. 01:30 | 0 |
| 2022.05.03. 01:45 | 0 |
| 2022.05.03. 02:00 | 0 |
| 2022.05.03. 02:15 | 0 |
| 2022.05.03. 02:30 | 0 |
| 2022.05.03. 02:45 | 0 |
| 2022.05.03. 03:00 | 0 |
| 2022.05.03. 03:15 | 0 |
| 2022.05.03. 03:30 | 0 |
| 2022.05.03. 03:45 | 0 |
| 2022.05.03. 04:00 | 0 |
| 2022.05.03. 04:15 | 0 |
| 2022.05.03. 04:30 | 0 |
| 2022.05.03. 04:45 | 0 |
| 2022.05.03. 05:00 | 0 |
| 2022.05.03. 05:15 | 0 |
| 2022.05.03. 05:30 | 0 |
| 2022.05.03. 05:45 | 0 |
| 2022.05.03. 06:00 | 0 |
| 2022.05.03. 06:15 | 0 |
| 2022.05.03. 06:30 | 0 |
| 2022.05.03. 06:45 | 0 |
| 2022.05.03. 07:00 | 0 |
| 2022.05.03. 07:15 | 0 |
| 2022.05.03. 07:30 | 0 |
| 2022.05.03. 07:45 | 0 |
| 2022.05.03. 08:00 | 0 |
| 2022.05.03. 08:15 | 0 |
| 2022.05.03. 08:30 | 0 |
| 2022.05.03. 08:45 | 0 |
| 2022.05.03. 09:00 | 0 |
| 2022.05.03. 09:15 | 0 |
| 2022.05.03. 09:30 | 0 |
| 2022.05.03. 09:45 | 0 |
| 2022.05.03. 10:00 | 0 |
| 2022.05.03. 10:15 | 0 |
| 2022.05.03. 10:30 | 0 |
| 2022.05.03. 10:45 | 0 |
| 2022.05.03. 11:00 | 0 |
| 2022.05.03. 11:15 | 0 |
| 2022.05.03. 11:30 | 0 |
| 2022.05.03. 11:45 | 0 |
| 2022.05.03. 12:00 | 0 |
| 2022.05.03. 12:15 | 0 |
| 2022.05.03. 12:30 | 0 |
| 2022.05.03. 12:45 | 0 |
| 2022.05.03. 13:00 | 0 |
| 2022.05.03. 13:15 | 0 |
| 2022.05.03. 13:30 | 0 |
| 2022.05.03. 13:45 | 0 |
| 2022.05.03. 14:00 | 0 |
| 2022.05.03. 14:15 | 0 |
| 2022.05.03. 14:30 | 0 |
| 2022.05.03. 14:45 | 0 |
| 2022.05.03. 15:00 | 0 |
| 2022.05.03. 15:15 | 0 |
| 2022.05.03. 15:30 | 0 |
| 2022.05.03. 15:45 | 0 |
| 2022.05.03. 16:00 | 0 |
| 2022.05.03. 16:15 | 0 |
| 2022.05.03. 16:30 | 0 |
| 2022.05.03. 16:45 | 0 |
| 2022.05.03. 17:00 | 0 |
| 2022.05.03. 17:15 | 0 |
| 2022.05.03. 17:30 | 0 |
| 2022.05.03. 17:45 | 0 |
| 2022.05.03. 18:00 | 0 |
| 2022.05.03. 18:15 | 0 |
| 2022.05.03. 18:30 | 0 |
| 2022.05.03. 18:45 | 0 |
| 2022.05.03. 19:00 | 0 |
| 2022.05.03. 19:15 | 0 |
| 2022.05.03. 19:30 | 0 |
| 2022.05.03. 19:45 | 0 |
| 2022.05.03. 20:00 | 0 |
| 2022.05.03. 20:15 | 0 |
| 2022.05.03. 20:30 | 0 |
| 2022.05.03. 20:45 | 0 |
| 2022.05.03. 21:00 | 0 |
| 2022.05.03. 21:15 | 0 |
| 2022.05.03. 21:30 | 0 |
| 2022.05.03. 21:45 | 0 |
| 2022.05.03. 22:00 | 0 |
| 2022.05.03. 22:15 | 0 |
| 2022.05.03. 22:30 | 0 |
| 2022.05.03. 22:45 | 0 |
| 2022.05.03. 23:00 | 0 |
| 2022.05.03. 23:15 | 0 |
| 2022.05.03. 23:30 | 0 |
| 2022.05.03. 23:45 | 0 |
| 2022.05.04. 00:00 | 0 |
| 2022.05.04. 00:15 | 0 |
| 2022.05.04. 00:30 | 0 |
| 2022.05.04. 00:45 | 0 |
| 2022.05.04. 01:00 | 0 |
| 2022.05.04. 01:15 | 0 |
| 2022.05.04. 01:30 | 0 |
| 2022.05.04. 01:45 | 0 |
| 2022.05.04. 02:00 | 0 |
| 2022.05.04. 02:15 | 0 |
| 2022.05.04. 02:30 | 0 |
| 2022.05.04. 02:45 | 0 |
| 2022.05.04. 03:00 | 0 |
| 2022.05.04. 03:15 | 0 |
| 2022.05.04. 03:30 | 0 |
| 2022.05.04. 03:45 | 0 |
| 2022.05.04. 04:00 | 0 |
| 2022.05.04. 04:15 | 0 |
| 2022.05.04. 04:30 | 0 |
| 2022.05.04. 04:45 | 0 |
| 2022.05.04. 05:00 | 0 |
| 2022.05.04. 05:15 | 0 |
| 2022.05.04. 05:30 | 0 |
| 2022.05.04. 05:45 | 0 |
| 2022.05.04. 06:00 | 0 |
| 2022.05.04. 06:15 | 0 |
| 2022.05.04. 06:30 | 0 |
| 2022.05.04. 06:45 | 0 |
| 2022.05.04. 07:00 | 0 |
| 2022.05.04. 07:15 | 0 |
| 2022.05.04. 07:30 | 0 |
| 2022.05.04. 07:45 | 0 |
| 2022.05.04. 08:00 | 0 |
| 2022.05.04. 08:15 | 0 |
| 2022.05.04. 08:30 | 0 |
| 2022.05.04. 08:45 | 0 |
| 2022.05.04. 09:00 | 0 |
| 2022.05.04. 09:15 | 0 |
| 2022.05.04. 09:30 | 0 |
| 2022.05.04. 09:45 | 0 |
| 2022.05.04. 10:00 | 0 |
| 2022.05.04. 10:15 | 0 |
| 2022.05.04. 10:30 | 0 |
| 2022.05.04. 10:45 | 0 |
| 2022.05.04. 11:00 | 0 |
| 2022.05.04. 11:15 | 0 |
| 2022.05.04. 11:30 | 0 |
| 2022.05.04. 11:45 | 0 |
| 2022.05.04. 12:00 | 0 |
| 2022.05.04. 12:15 | 0 |
| 2022.05.04. 12:30 | 0 |
| 2022.05.04. 12:45 | 0 |
| 2022.05.04. 13:00 | 0 |
| 2022.05.04. 13:15 | 0 |
| 2022.05.04. 13:30 | 0 |
| 2022.05.04. 13:45 | 0 |
| 2022.05.04. 14:00 | 0 |
| 2022.05.04. 14:15 | 0 |
| 2022.05.04. 14:30 | 0 |
| 2022.05.04. 14:45 | 0 |
| 2022.05.04. 15:00 | 0 |
| 2022.05.04. 15:15 | 0 |
| 2022.05.04. 15:30 | 0 |
| 2022.05.04. 15:45 | 0 |
| 2022.05.04. 16:00 | 0 |
| 2022.05.04. 16:15 | 0 |
| 2022.05.04. 16:30 | 0 |
| 2022.05.04. 16:45 | 0 |
| 2022.05.04. 17:00 | 0 |
| 2022.05.04. 17:15 | 0 |
| 2022.05.04. 17:30 | 0 |
| 2022.05.04. 17:45 | 0 |
| 2022.05.04. 18:00 | 0 |
| 2022.05.04. 18:15 | 0 |
| 2022.05.04. 18:30 | 0 |
| 2022.05.04. 18:45 | 0 |
| 2022.05.04. 19:00 | 0 |
| 2022.05.04. 19:15 | 0 |
| 2022.05.04. 19:30 | 0 |
| 2022.05.04. 19:45 | 0 |
| 2022.05.04. 20:00 | 0 |
| 2022.05.04. 20:15 | 0 |
| 2022.05.04. 20:30 | 0 |
| 2022.05.04. 20:45 | 0 |
| 2022.05.04. 21:00 | 0 |
| 2022.05.04. 21:15 | 0 |
| 2022.05.04. 21:30 | 0 |
| 2022.05.04. 21:45 | 0 |
| 2022.05.04. 22:00 | 0 |
| 2022.05.04. 22:15 | 0 |
| 2022.05.04. 22:30 | 0 |
| 2022.05.04. 22:45 | 0 |
| 2022.05.04. 23:00 | 0 |
| 2022.05.04. 23:15 | 0 |
| 2022.05.04. 23:30 | 0 |
| 2022.05.04. 23:45 | 0 |
| 2022.05.05. 00:00 | 0 |
| 2022.05.05. 00:15 | 0 |
| 2022.05.05. 00:30 | 0 |
| 2022.05.05. 00:45 | 0 |
| 2022.05.05. 01:00 | 0 |
| 2022.05.05. 01:15 | 0 |
| 2022.05.05. 01:30 | 0 |
| 2022.05.05. 01:45 | 0 |
| 2022.05.05. 02:00 | 0 |
| 2022.05.05. 02:15 | 0 |
| 2022.05.05. 02:30 | 0 |
| 2022.05.05. 02:45 | 0 |
| 2022.05.05. 03:00 | 0 |
| 2022.05.05. 03:15 | 0 |
| 2022.05.05. 03:30 | 0 |
| 2022.05.05. 03:45 | 0 |
| 2022.05.05. 04:00 | 0 |
| 2022.05.05. 04:15 | 0 |
| 2022.05.05. 04:30 | 0 |
| 2022.05.05. 04:45 | 0 |
| 2022.05.05. 05:00 | 0 |
| 2022.05.05. 05:15 | 0 |
| 2022.05.05. 05:30 | 0 |
| 2022.05.05. 05:45 | 0 |
| 2022.05.05. 06:00 | 0 |
| 2022.05.05. 06:15 | 0 |
| 2022.05.05. 06:30 | 0 |
| 2022.05.05. 06:45 | 0 |
| 2022.05.05. 07:00 | 0 |
| 2022.05.05. 07:15 | 0 |
| 2022.05.05. 07:30 | 0 |
| 2022.05.05. 07:45 | 0 |
| 2022.05.05. 08:00 | 0 |
| 2022.05.05. 08:15 | 0 |
| 2022.05.05. 08:30 | 0 |
| 2022.05.05. 08:45 | 0 |
| 2022.05.05. 09:00 | 0 |
| 2022.05.05. 09:15 | 0 |
| 2022.05.05. 09:30 | 0 |
| 2022.05.05. 09:45 | 0 |
| 2022.05.05. 10:00 | 0 |
| 2022.05.05. 10:15 | 0 |
| 2022.05.05. 10:30 | 0 |
| 2022.05.05. 10:45 | 0 |
| 2022.05.05. 11:00 | 0 |
| 2022.05.05. 11:15 | 0 |
| 2022.05.05. 11:30 | 0 |
| 2022.05.05. 11:45 | 0 |
| 2022.05.05. 12:00 | 0 |
| 2022.05.05. 12:15 | 0 |
| 2022.05.05. 12:30 | 0 |
| 2022.05.05. 12:45 | 0 |
| 2022.05.05. 13:00 | 0 |
| 2022.05.05. 13:15 | 0 |
| 2022.05.05. 13:30 | 0 |
| 2022.05.05. 13:45 | 0 |
| 2022.05.05. 14:00 | 0 |
| 2022.05.05. 14:15 | 0 |
| 2022.05.05. 14:30 | 0 |
| 2022.05.05. 14:45 | 0 |
| 2022.05.05. 15:00 | 0 |
| 2022.05.05. 15:15 | 0 |
| 2022.05.05. 15:30 | 0 |
| 2022.05.05. 15:45 | 0 |
| 2022.05.05. 16:00 | 0 |
| 2022.05.05. 16:15 | 0 |
| 2022.05.05. 16:30 | 0 |
| 2022.05.05. 16:45 | 0 |
| 2022.05.05. 17:00 | 0 |
| 2022.05.05. 17:15 | 0 |
| 2022.05.05. 17:30 | 0 |
| 2022.05.05. 17:45 | 0 |
| 2022.05.05. 18:00 | 0 |
| 2022.05.05. 18:15 | 0 |
| 2022.05.05. 18:30 | 0 |
| 2022.05.05. 18:45 | 0 |
| 2022.05.05. 19:00 | 0 |
| 2022.05.05. 19:15 | 0 |
| 2022.05.05. 19:30 | 0 |
| 2022.05.05. 19:45 | 0 |
| 2022.05.05. 20:00 | 0 |
| 2022.05.05. 20:15 | 0 |
| 2022.05.05. 20:30 | 0 |
| 2022.05.05. 20:45 | 0 |
| 2022.05.05. 21:00 | 0 |
| 2022.05.05. 21:15 | 0 |
| 2022.05.05. 21:30 | 0 |
| 2022.05.05. 21:45 | 0 |
| 2022.05.05. 22:00 | 0 |
| 2022.05.05. 22:15 | 0 |
| 2022.05.05. 22:30 | 0 |
| 2022.05.05. 22:45 | 0 |
| 2022.05.05. 23:00 | 0 |
| 2022.05.05. 23:15 | 0 |
| 2022.05.05. 23:30 | 0 |
| 2022.05.05. 23:45 | 0 |
| 2022.05.06. 00:00 | 0 |
| 2022.05.06. 00:15 | 0 |
| 2022.05.06. 00:30 | 0 |
| 2022.05.06. 00:45 | 0 |
| 2022.05.06. 01:00 | 0 |
| 2022.05.06. 01:15 | 0 |
| 2022.05.06. 01:30 | 0 |
| 2022.05.06. 01:45 | 0 |
| 2022.05.06. 02:00 | 0 |
| 2022.05.06. 02:15 | 0 |
| 2022.05.06. 02:30 | 0 |
| 2022.05.06. 02:45 | 0 |
| 2022.05.06. 03:00 | 0 |
| 2022.05.06. 03:15 | 0 |
| 2022.05.06. 03:30 | 0 |
| 2022.05.06. 03:45 | 0 |
| 2022.05.06. 04:00 | 0 |
| 2022.05.06. 04:15 | 0 |
| 2022.05.06. 04:30 | 0 |
| 2022.05.06. 04:45 | 0 |
| 2022.05.06. 05:00 | 0 |
| 2022.05.06. 05:15 | 0 |
| 2022.05.06. 05:30 | 0 |
| 2022.05.06. 05:45 | 0 |
| 2022.05.06. 06:00 | 0 |
| 2022.05.06. 06:15 | 0 |
| 2022.05.06. 06:30 | 0 |
| 2022.05.06. 06:45 | 0 |
| 2022.05.06. 07:00 | 0 |
| 2022.05.06. 07:15 | 0 |
| 2022.05.06. 07:30 | 0 |
| 2022.05.06. 07:45 | 0 |
| 2022.05.06. 08:00 | 0 |
| 2022.05.06. 08:15 | 0 |
| 2022.05.06. 08:30 | 0 |
| 2022.05.06. 08:45 | 0 |
| 2022.05.06. 09:00 | 0 |
| 2022.05.06. 09:15 | 0 |
| 2022.05.06. 09:30 | 0 |
| 2022.05.06. 09:45 | 0 |
| 2022.05.06. 10:00 | 0 |
| 2022.05.06. 10:15 | 0 |
| 2022.05.06. 10:30 | 0 |
| 2022.05.06. 10:45 | 0 |
| 2022.05.06. 11:00 | 0 |
| 2022.05.06. 11:15 | 0 |
| 2022.05.06. 11:30 | 0 |
| 2022.05.06. 11:45 | 0 |
| 2022.05.06. 12:00 | 0 |
| 2022.05.06. 12:15 | 0 |
| 2022.05.06. 12:30 | 0 |
| 2022.05.06. 12:45 | 0 |
| 2022.05.06. 13:00 | 0 |
| 2022.05.06. 13:15 | 0 |
| 2022.05.06. 13:30 | 0 |
| 2022.05.06. 13:45 | 0 |
| 2022.05.06. 14:00 | 0 |
| 2022.05.06. 14:15 | 0 |
| 2022.05.06. 14:30 | 0 |
| 2022.05.06. 14:45 | 0 |
| 2022.05.06. 15:00 | 0 |
| 2022.05.06. 15:15 | 0 |
| 2022.05.06. 15:30 | 0 |
| 2022.05.06. 15:45 | 0 |
| 2022.05.06. 16:00 | 0 |
| 2022.05.06. 16:15 | 0 |
| 2022.05.06. 16:30 | 0 |
| 2022.05.06. 16:45 | 0 |
| 2022.05.06. 17:00 | 0 |
| 2022.05.06. 17:15 | 0 |
| 2022.05.06. 17:30 | 0 |
| 2022.05.06. 17:45 | 0 |
| 2022.05.06. 18:00 | 0 |
| 2022.05.06. 18:15 | 0 |
| 2022.05.06. 18:30 | 0 |
| 2022.05.06. 18:45 | 0 |
| 2022.05.06. 19:00 | 0 |
| 2022.05.06. 19:15 | 0 |
| 2022.05.06. 19:30 | 0 |
| 2022.05.06. 19:45 | 0 |
| 2022.05.06. 20:00 | 0 |
| 2022.05.06. 20:15 | 0 |
| 2022.05.06. 20:30 | 0 |
| 2022.05.06. 20:45 | 0 |
| 2022.05.06. 21:00 | 0 |
| 2022.05.06. 21:15 | 0 |
| 2022.05.06. 21:30 | 0 |
| 2022.05.06. 21:45 | 0 |
| 2022.05.06. 22:00 | 0 |
| 2022.05.06. 22:15 | 0 |
| 2022.05.06. 22:30 | 0 |
| 2022.05.06. 22:45 | 0 |
| 2022.05.06. 23:00 | 0 |
| 2022.05.06. 23:15 | 0 |
| 2022.05.06. 23:30 | 0 |
| 2022.05.06. 23:45 | 0 |
| 2022.05.07. 00:00 | 0 |
| 2022.05.07. 00:15 | 0 |
| 2022.05.07. 00:30 | 0 |
| 2022.05.07. 00:45 | 0 |
| 2022.05.07. 01:00 | 0 |
| 2022.05.07. 01:15 | 0 |
| 2022.05.07. 01:30 | 0 |
| 2022.05.07. 01:45 | 0 |
| 2022.05.07. 02:00 | 0 |
| 2022.05.07. 02:15 | 0 |
| 2022.05.07. 02:30 | 0 |
| 2022.05.07. 02:45 | 0 |
| 2022.05.07. 03:00 | 0 |
| 2022.05.07. 03:15 | 0 |
| 2022.05.07. 03:30 | 0 |
| 2022.05.07. 03:45 | 0 |
| 2022.05.07. 04:00 | 0 |
| 2022.05.07. 04:15 | 0 |
| 2022.05.07. 04:30 | 0 |
| 2022.05.07. 04:45 | 0 |
| 2022.05.07. 05:00 | 0 |
| 2022.05.07. 05:15 | 0 |
| 2022.05.07. 05:30 | 0 |
| 2022.05.07. 05:45 | 0 |
| 2022.05.07. 06:00 | 0 |
| 2022.05.07. 06:15 | 0 |
| 2022.05.07. 06:30 | 0 |
| 2022.05.07. 06:45 | 0 |
| 2022.05.07. 07:00 | 0 |
| 2022.05.07. 07:15 | 0 |
| 2022.05.07. 07:30 | 0 |
| 2022.05.07. 07:45 | 0 |
| 2022.05.07. 08:00 | 0 |
| 2022.05.07. 08:15 | 0 |
| 2022.05.07. 08:30 | 0 |
| 2022.05.07. 08:45 | 0 |
| 2022.05.07. 09:00 | 0 |
| 2022.05.07. 09:15 | 0 |
| 2022.05.07. 09:30 | 0 |
| 2022.05.07. 09:45 | 0 |
| 2022.05.07. 10:00 | 0 |
| 2022.05.07. 10:15 | 0 |
| 2022.05.07. 10:30 | 0 |
| 2022.05.07. 10:45 | 0 |
| 2022.05.07. 11:00 | 0 |
| 2022.05.07. 11:15 | 0 |
| 2022.05.07. 11:30 | 0 |
| 2022.05.07. 11:45 | 0 |
| 2022.05.07. 12:00 | 0 |
| 2022.05.07. 12:15 | 0 |
| 2022.05.07. 12:30 | 0 |
| 2022.05.07. 12:45 | 0 |
| 2022.05.07. 13:00 | 0 |
| 2022.05.07. 13:15 | 0 |
| 2022.05.07. 13:30 | 0 |
| 2022.05.07. 13:45 | 0 |
| 2022.05.07. 14:00 | 0 |
| 2022.05.07. 14:15 | 0 |
| 2022.05.07. 14:30 | 0 |
| 2022.05.07. 14:45 | 0 |
| 2022.05.07. 15:00 | 0 |
| 2022.05.07. 15:15 | 0 |
| 2022.05.07. 15:30 | 0 |
| 2022.05.07. 15:45 | 0 |
| 2022.05.07. 16:00 | 0 |
| 2022.05.07. 16:15 | 0 |
| 2022.05.07. 16:30 | 0 |
| 2022.05.07. 16:45 | 0 |
| 2022.05.07. 17:00 | 0 |
| 2022.05.07. 17:15 | 0 |
| 2022.05.07. 17:30 | 0 |
| 2022.05.07. 17:45 | 0 |
| 2022.05.07. 18:00 | 0 |
| 2022.05.07. 18:15 | 0 |
| 2022.05.07. 18:30 | 0 |
| 2022.05.07. 18:45 | 0 |
| 2022.05.07. 19:00 | 0 |
| 2022.05.07. 19:15 | 0 |
| 2022.05.07. 19:30 | 0 |
| 2022.05.07. 19:45 | 0 |
| 2022.05.07. 20:00 | 0 |
| 2022.05.07. 20:15 | 0 |
| 2022.05.07. 20:30 | 0 |
| 2022.05.07. 20:45 | 0 |
| 2022.05.07. 21:00 | 0 |
| 2022.05.07. 21:15 | 0 |
| 2022.05.07. 21:30 | 0 |
| 2022.05.07. 21:45 | 0 |
| 2022.05.07. 22:00 | 0 |
| 2022.05.07. 22:15 | 0 |
| 2022.05.07. 22:30 | 0 |
| 2022.05.07. 22:45 | 0 |
| 2022.05.07. 23:00 | 0 |
| 2022.05.07. 23:15 | 0 |
| 2022.05.07. 23:30 | 0 |
| 2022.05.07. 23:45 | 0 |
| 2022.05.08. 00:00 | 0 |
| 2022.05.08. 00:15 | 0 |
| 2022.05.08. 00:30 | 0 |
| 2022.05.08. 00:45 | 0 |
| 2022.05.08. 01:00 | 0 |
| 2022.05.08. 01:15 | 0 |
| 2022.05.08. 01:30 | 0 |
| 2022.05.08. 01:45 | 0 |
| 2022.05.08. 02:00 | 0 |
| 2022.05.08. 02:15 | 0 |
| 2022.05.08. 02:30 | 0 |
| 2022.05.08. 02:45 | 0 |
| 2022.05.08. 03:00 | 0 |
| 2022.05.08. 03:15 | 0 |
| 2022.05.08. 03:30 | 0 |
| 2022.05.08. 03:45 | 0 |
| 2022.05.08. 04:00 | 0 |
| 2022.05.08. 04:15 | 0 |
| 2022.05.08. 04:30 | 0 |
| 2022.05.08. 04:45 | 0 |
| 2022.05.08. 05:00 | 0 |
| 2022.05.08. 05:15 | 0 |
| 2022.05.08. 05:30 | 0 |
| 2022.05.08. 05:45 | 0 |
| 2022.05.08. 06:00 | 0 |
| 2022.05.08. 06:15 | 0 |
| 2022.05.08. 06:30 | 0 |
| 2022.05.08. 06:45 | 0 |
| 2022.05.08. 07:00 | 0 |
| 2022.05.08. 07:15 | 0 |
| 2022.05.08. 07:30 | 0 |
| 2022.05.08. 07:45 | 0 |
| 2022.05.08. 08:00 | 0 |
| 2022.05.08. 08:15 | 0 |
| 2022.05.08. 08:30 | 0 |
| 2022.05.08. 08:45 | 0 |
| 2022.05.08. 09:00 | 0 |
| 2022.05.08. 09:15 | 0 |
| 2022.05.08. 09:30 | 0 |
| 2022.05.08. 09:45 | 0 |
| 2022.05.08. 10:00 | 0 |
| 2022.05.08. 10:15 | 0 |
| 2022.05.08. 10:30 | 0 |
| 2022.05.08. 10:45 | 0 |
| 2022.05.08. 11:00 | 0 |
| 2022.05.08. 11:15 | 0 |
| 2022.05.08. 11:30 | 0 |
| 2022.05.08. 11:45 | 0 |
| 2022.05.08. 12:00 | 0 |
| 2022.05.08. 12:15 | 0 |
| 2022.05.08. 12:30 | 0 |
| 2022.05.08. 12:45 | 0 |
| 2022.05.08. 13:00 | 0 |
| 2022.05.08. 13:15 | 0 |
| 2022.05.08. 13:30 | 0 |
| 2022.05.08. 13:45 | 0 |
| 2022.05.08. 14:00 | 0 |
| 2022.05.08. 14:15 | 0 |
| 2022.05.08. 14:30 | 0 |
| 2022.05.08. 14:45 | 0 |
| 2022.05.08. 15:00 | 0 |
| 2022.05.08. 15:15 | 0 |
| 2022.05.08. 15:30 | 0 |
| 2022.05.08. 15:45 | 0 |
| 2022.05.08. 16:00 | 0 |
| 2022.05.08. 16:15 | 0 |
| 2022.05.08. 16:30 | 0 |
| 2022.05.08. 16:45 | 0 |
| 2022.05.08. 17:00 | 0 |
| 2022.05.08. 17:15 | 0 |
| 2022.05.08. 17:30 | 0 |
| 2022.05.08. 17:45 | 0 |
| 2022.05.08. 18:00 | 0 |
| 2022.05.08. 18:15 | 0 |
| 2022.05.08. 18:30 | 0 |
| 2022.05.08. 18:45 | 0 |
| 2022.05.08. 19:00 | 0 |
| 2022.05.08. 19:15 | 0 |
| 2022.05.08. 19:30 | 0 |
| 2022.05.08. 19:45 | 0 |
| 2022.05.08. 20:00 | 0 |
| 2022.05.08. 20:15 | 0 |
| 2022.05.08. 20:30 | 0 |
| 2022.05.08. 20:45 | 0 |
| 2022.05.08. 21:00 | 0 |
| 2022.05.08. 21:15 | 0 |
| 2022.05.08. 21:30 | 0 |
| 2022.05.08. 21:45 | 0 |
| 2022.05.08. 22:00 | 0 |
| 2022.05.08. 22:15 | 0 |
| 2022.05.08. 22:30 | 0 |
| 2022.05.08. 22:45 | 0 |
| 2022.05.08. 23:00 | 0 |
| 2022.05.08. 23:15 | 0 |
| 2022.05.08. 23:30 | 0 |
| 2022.05.08. 23:45 | 0 |
| 2022.05.09. 00:00 | 0 |
| 2022.05.09. 00:15 | 0 |
| 2022.05.09. 00:30 | 0 |
| 2022.05.09. 00:45 | 0 |
| 2022.05.09. 01:00 | 0 |
| 2022.05.09. 01:15 | 0 |
| 2022.05.09. 01:30 | 0 |
| 2022.05.09. 01:45 | 0 |
| 2022.05.09. 02:00 | 0 |
| 2022.05.09. 02:15 | 0 |
| 2022.05.09. 02:30 | 0 |
| 2022.05.09. 02:45 | 0 |
| 2022.05.09. 03:00 | 0 |
| 2022.05.09. 03:15 | 0 |
| 2022.05.09. 03:30 | 0 |
| 2022.05.09. 03:45 | 0 |
| 2022.05.09. 04:00 | 0 |
| 2022.05.09. 04:15 | 0 |
| 2022.05.09. 04:30 | 0 |
| 2022.05.09. 04:45 | 0 |
| 2022.05.09. 05:00 | 0 |
| 2022.05.09. 05:15 | 0 |
| 2022.05.09. 05:30 | 0 |
| 2022.05.09. 05:45 | 0 |
| 2022.05.09. 06:00 | 0 |
| 2022.05.09. 06:15 | 0 |
| 2022.05.09. 06:30 | 0 |
| 2022.05.09. 06:45 | 0 |
| 2022.05.09. 07:00 | 0 |
| 2022.05.09. 07:15 | 0 |
| 2022.05.09. 07:30 | 0 |
| 2022.05.09. 07:45 | 0 |
| 2022.05.09. 08:00 | 0 |
| 2022.05.09. 08:15 | 0 |
| 2022.05.09. 08:30 | 0 |
| 2022.05.09. 08:45 | 0 |
| 2022.05.09. 09:00 | 0 |
| 2022.05.09. 09:15 | 0 |
| 2022.05.09. 09:30 | 0 |
| 2022.05.09. 09:45 | 0 |
| 2022.05.09. 10:00 | 0 |
| 2022.05.09. 10:15 | 0 |
| 2022.05.09. 10:30 | 0 |
| 2022.05.09. 10:45 | 0 |
| 2022.05.09. 11:00 | 0 |
| 2022.05.09. 11:15 | 0 |
| 2022.05.09. 11:30 | 0 |
| 2022.05.09. 11:45 | 0 |
| 2022.05.09. 12:00 | 0 |
| 2022.05.09. 12:15 | 0 |
| 2022.05.09. 12:30 | 0 |
| 2022.05.09. 12:45 | 0 |
| 2022.05.09. 13:00 | 0 |
| 2022.05.09. 13:15 | 0 |
| 2022.05.09. 13:30 | 0 |
| 2022.05.09. 13:45 | 0 |
| 2022.05.09. 14:00 | 0 |
| 2022.05.09. 14:15 | 0 |
| 2022.05.09. 14:30 | 0 |
| 2022.05.09. 14:45 | 0 |
| 2022.05.09. 15:00 | 0 |
| 2022.05.09. 15:15 | 0 |
| 2022.05.09. 15:30 | 0 |
| 2022.05.09. 15:45 | 0 |
| 2022.05.09. 16:00 | 0 |
| 2022.05.09. 16:15 | 0 |
| 2022.05.09. 16:30 | 0 |
| 2022.05.09. 16:45 | 0 |
| 2022.05.09. 17:00 | 0 |
| 2022.05.09. 17:15 | 0 |
| 2022.05.09. 17:30 | 0 |
| 2022.05.09. 17:45 | 0 |
| 2022.05.09. 18:00 | 0 |
| 2022.05.09. 18:15 | 0 |
| 2022.05.09. 18:30 | 0 |
| 2022.05.09. 18:45 | 0 |
| 2022.05.09. 19:00 | 0 |
| 2022.05.09. 19:15 | 0 |
| 2022.05.09. 19:30 | 0 |
| 2022.05.09. 19:45 | 0 |
| 2022.05.09. 20:00 | 0 |
| 2022.05.09. 20:15 | 0 |
| 2022.05.09. 20:30 | 0 |
| 2022.05.09. 20:45 | 0 |
| 2022.05.09. 21:00 | 0 |
| 2022.05.09. 21:15 | 0 |
| 2022.05.09. 21:30 | 0 |
| 2022.05.09. 21:45 | 0 |
| 2022.05.09. 22:00 | 0 |
| 2022.05.09. 22:15 | 0 |
| 2022.05.09. 22:30 | 0 |
| 2022.05.09. 22:45 | 0 |
| 2022.05.09. 23:00 | 0 |
| 2022.05.09. 23:15 | 0 |
| 2022.05.09. 23:30 | 0 |
| 2022.05.09. 23:45 | 0 |
| 2022.05.10. 00:00 | 0 |
| 2022.05.10. 00:15 | 0 |
| 2022.05.10. 00:30 | 0 |
| 2022.05.10. 00:45 | 0 |
| 2022.05.10. 01:00 | 0 |
| 2022.05.10. 01:15 | 0 |
| 2022.05.10. 01:30 | 0 |
| 2022.05.10. 01:45 | 0 |
| 2022.05.10. 02:00 | 0 |
| 2022.05.10. 02:15 | 0 |
| 2022.05.10. 02:30 | 0 |
| 2022.05.10. 02:45 | 0 |
| 2022.05.10. 03:00 | 0 |
| 2022.05.10. 03:15 | 0 |
| 2022.05.10. 03:30 | 0 |
| 2022.05.10. 03:45 | 0 |
| 2022.05.10. 04:00 | 0 |
| 2022.05.10. 04:15 | 0 |
| 2022.05.10. 04:30 | 0 |
| 2022.05.10. 04:45 | 0 |
| 2022.05.10. 05:00 | 0 |
| 2022.05.10. 05:15 | 0 |
| 2022.05.10. 05:30 | 0 |
| 2022.05.10. 05:45 | 0 |
| 2022.05.10. 06:00 | 0 |
| 2022.05.10. 06:15 | 0 |
| 2022.05.10. 06:30 | 0 |
| 2022.05.10. 06:45 | 0 |
| 2022.05.10. 07:00 | 0 |
| 2022.05.10. 07:15 | 0 |
| 2022.05.10. 07:30 | 0 |
| 2022.05.10. 07:45 | 0 |
| 2022.05.10. 08:00 | 0 |
| 2022.05.10. 08:15 | 0 |
| 2022.05.10. 08:30 | 0 |
| 2022.05.10. 08:45 | 0 |
| 2022.05.10. 09:00 | 0 |
| 2022.05.10. 09:15 | 0 |
| 2022.05.10. 09:30 | 0 |
| 2022.05.10. 09:45 | 0 |
| 2022.05.10. 10:00 | 0 |
| 2022.05.10. 10:15 | 0 |
| 2022.05.10. 10:30 | 0 |
| 2022.05.10. 10:45 | 0 |
| 2022.05.10. 11:00 | 0 |
| 2022.05.10. 11:15 | 0 |
| 2022.05.10. 11:30 | 0 |
| 2022.05.10. 11:45 | 0 |
| 2022.05.10. 12:00 | 0 |
| 2022.05.10. 12:15 | 0 |
| 2022.05.10. 12:30 | 0 |
| 2022.05.10. 12:45 | 0 |
| 2022.05.10. 13:00 | 0 |
| 2022.05.10. 13:15 | 0 |
| 2022.05.10. 13:30 | 0 |
| 2022.05.10. 13:45 | 0 |
| 2022.05.10. 14:00 | 0 |
| 2022.05.10. 14:15 | 0 |
| 2022.05.10. 14:30 | 0 |
| 2022.05.10. 14:45 | 0 |
| 2022.05.10. 15:00 | 0 |
| 2022.05.10. 15:15 | 0 |
| 2022.05.10. 15:30 | 0 |
| 2022.05.10. 15:45 | 0 |
| 2022.05.10. 16:00 | 0 |
| 2022.05.10. 16:15 | 0 |
| 2022.05.10. 16:30 | 0 |
| 2022.05.10. 16:45 | 0 |
| 2022.05.10. 17:00 | 0 |
| 2022.05.10. 17:15 | 0 |
| 2022.05.10. 17:30 | 0 |
| 2022.05.10. 17:45 | 0 |
| 2022.05.10. 18:00 | 0 |
| 2022.05.10. 18:15 | 0 |
| 2022.05.10. 18:30 | 0 |
| 2022.05.10. 18:45 | 0 |
| 2022.05.10. 19:00 | 0 |
| 2022.05.10. 19:15 | 0 |
| 2022.05.10. 19:30 | 0 |
| 2022.05.10. 19:45 | 0 |
| 2022.05.10. 20:00 | 0 |
| 2022.05.10. 20:15 | 0 |
| 2022.05.10. 20:30 | 0 |
| 2022.05.10. 20:45 | 0 |
| 2022.05.10. 21:00 | 0 |
| 2022.05.10. 21:15 | 0 |
| 2022.05.10. 21:30 | 0 |
| 2022.05.10. 21:45 | 0 |
| 2022.05.10. 22:00 | 0 |
| 2022.05.10. 22:15 | 0 |
| 2022.05.10. 22:30 | 0 |
| 2022.05.10. 22:45 | 0 |
| 2022.05.10. 23:00 | 0 |
| 2022.05.10. 23:15 | 0 |
| 2022.05.10. 23:30 | 0 |
| 2022.05.10. 23:45 | 0 |
| 2022.05.11. 00:00 | 0 |
| 2022.05.11. 00:15 | 0 |
| 2022.05.11. 00:30 | 0 |
| 2022.05.11. 00:45 | 0 |
| 2022.05.11. 01:00 | 0 |
| 2022.05.11. 01:15 | 0 |
| 2022.05.11. 01:30 | 0 |
| 2022.05.11. 01:45 | 0 |
| 2022.05.11. 02:00 | 0 |
| 2022.05.11. 02:15 | 0 |
| 2022.05.11. 02:30 | 0 |
| 2022.05.11. 02:45 | 0 |
| 2022.05.11. 03:00 | 0 |
| 2022.05.11. 03:15 | 0 |
| 2022.05.11. 03:30 | 0 |
| 2022.05.11. 03:45 | 0 |
| 2022.05.11. 04:00 | 0 |
| 2022.05.11. 04:15 | 0 |
| 2022.05.11. 04:30 | 0 |
| 2022.05.11. 04:45 | 0 |
| 2022.05.11. 05:00 | 0 |
| 2022.05.11. 05:15 | 0 |
| 2022.05.11. 05:30 | 0 |
| 2022.05.11. 05:45 | 0 |
| 2022.05.11. 06:00 | 0 |
| 2022.05.11. 06:15 | 0 |
| 2022.05.11. 06:30 | 0 |
| 2022.05.11. 06:45 | 0 |
| 2022.05.11. 07:00 | 0 |
| 2022.05.11. 07:15 | 0 |
| 2022.05.11. 07:30 | 0 |
| 2022.05.11. 07:45 | 0 |
| 2022.05.11. 08:00 | 0 |
| 2022.05.11. 08:15 | 0 |
| 2022.05.11. 08:30 | 0 |
| 2022.05.11. 08:45 | 0 |
| 2022.05.11. 09:00 | 0 |
| 2022.05.11. 09:15 | 0 |
| 2022.05.11. 09:30 | 0 |
| 2022.05.11. 09:45 | 0 |
| 2022.05.11. 10:00 | 0 |
| 2022.05.11. 10:15 | 0 |
| 2022.05.11. 10:30 | 0 |
| 2022.05.11. 10:45 | 0 |
| 2022.05.11. 11:00 | 0 |
| 2022.05.11. 11:15 | 0 |
| 2022.05.11. 11:30 | 0 |
| 2022.05.11. 11:45 | 0 |
| 2022.05.11. 12:00 | 0 |
| 2022.05.11. 12:15 | 0 |
| 2022.05.11. 12:30 | 0 |
| 2022.05.11. 12:45 | 0 |
| 2022.05.11. 13:00 | 0 |
| 2022.05.11. 13:15 | 0 |
| 2022.05.11. 13:30 | 0 |
| 2022.05.11. 13:45 | 0 |
| 2022.05.11. 14:00 | 0 |
| 2022.05.11. 14:15 | 0 |
| 2022.05.11. 14:30 | 0 |
| 2022.05.11. 14:45 | 0 |
| 2022.05.11. 15:00 | 0 |
| 2022.05.11. 15:15 | 0 |
| 2022.05.11. 15:30 | 0 |
| 2022.05.11. 15:45 | 0 |
| 2022.05.11. 16:00 | 0 |
| 2022.05.11. 16:15 | 0 |
| 2022.05.11. 16:30 | 0 |
| 2022.05.11. 16:45 | 0 |
| 2022.05.11. 17:00 | 0 |
| 2022.05.11. 17:15 | 0 |
| 2022.05.11. 17:30 | 0 |
| 2022.05.11. 17:45 | 0 |
| 2022.05.11. 18:00 | 0 |
| 2022.05.11. 18:15 | 0 |
| 2022.05.11. 18:30 | 0 |
| 2022.05.11. 18:45 | 0 |
| 2022.05.11. 19:00 | 0 |
| 2022.05.11. 19:15 | 0 |
| 2022.05.11. 19:30 | 0 |
| 2022.05.11. 19:45 | 0 |
| 2022.05.11. 20:00 | 0 |
| 2022.05.11. 20:15 | 0 |
| 2022.05.11. 20:30 | 0 |
| 2022.05.11. 20:45 | 0 |
| 2022.05.11. 21:00 | 0 |
| 2022.05.11. 21:15 | 0 |
| 2022.05.11. 21:30 | 0 |
| 2022.05.11. 21:45 | 0 |
| 2022.05.11. 22:00 | 0 |
| 2022.05.11. 22:15 | 0 |
| 2022.05.11. 22:30 | 0 |
| 2022.05.11. 22:45 | 0 |
| 2022.05.11. 23:00 | 0 |
| 2022.05.11. 23:15 | 0 |
| 2022.05.11. 23:30 | 0 |
| 2022.05.11. 23:45 | 0 |
| 2022.05.12. 00:00 | 0 |
| 2022.05.12. 00:15 | 0 |
| 2022.05.12. 00:30 | 0 |
| 2022.05.12. 00:45 | 0 |
| 2022.05.12. 01:00 | 0 |
| 2022.05.12. 01:15 | 0 |
| 2022.05.12. 01:30 | 0 |
| 2022.05.12. 01:45 | 0 |
| 2022.05.12. 02:00 | 0 |
| 2022.05.12. 02:15 | 0 |
| 2022.05.12. 02:30 | 0 |
| 2022.05.12. 02:45 | 0 |
| 2022.05.12. 03:00 | 0 |
| 2022.05.12. 03:15 | 0 |
| 2022.05.12. 03:30 | 0 |
| 2022.05.12. 03:45 | 0 |
| 2022.05.12. 04:00 | 0 |
| 2022.05.12. 04:15 | 0 |
| 2022.05.12. 04:30 | 0 |
| 2022.05.12. 04:45 | 0 |
| 2022.05.12. 05:00 | 0 |
| 2022.05.12. 05:15 | 0 |
| 2022.05.12. 05:30 | 0 |
| 2022.05.12. 05:45 | 0 |
| 2022.05.12. 06:00 | 0 |
| 2022.05.12. 06:15 | 0 |
| 2022.05.12. 06:30 | 0 |
| 2022.05.12. 06:45 | 0 |
| 2022.05.12. 07:00 | 0 |
| 2022.05.12. 07:15 | 0 |
| 2022.05.12. 07:30 | 0 |
| 2022.05.12. 07:45 | 0 |
| 2022.05.12. 08:00 | 0 |
| 2022.05.12. 08:15 | 0 |
| 2022.05.12. 08:30 | 0 |
| 2022.05.12. 08:45 | 0 |
| 2022.05.12. 09:00 | 0 |
| 2022.05.12. 09:15 | 0 |
| 2022.05.12. 09:30 | 0 |
| 2022.05.12. 09:45 | 0 |
| 2022.05.12. 10:00 | 0 |
| 2022.05.12. 10:15 | 0 |
| 2022.05.12. 10:30 | 0 |
| 2022.05.12. 10:45 | 0 |
| 2022.05.12. 11:00 | 0 |
| 2022.05.12. 11:15 | 0 |
| 2022.05.12. 11:30 | 0 |
| 2022.05.12. 11:45 | 0 |
| 2022.05.12. 12:00 | 0 |
| 2022.05.12. 12:15 | 0 |
| 2022.05.12. 12:30 | 0 |
| 2022.05.12. 12:45 | 0 |
| 2022.05.12. 13:00 | 0 |
| 2022.05.12. 13:15 | 0 |
| 2022.05.12. 13:30 | 0 |
| 2022.05.12. 13:45 | 0 |
| 2022.05.12. 14:00 | 0 |
| 2022.05.12. 14:15 | 0 |
| 2022.05.12. 14:30 | 0 |
| 2022.05.12. 14:45 | 0 |
| 2022.05.12. 15:00 | 0 |
| 2022.05.12. 15:15 | 0 |
| 2022.05.12. 15:30 | 0 |
| 2022.05.12. 15:45 | 0 |
| 2022.05.12. 16:00 | 0 |
| 2022.05.12. 16:15 | 0 |
| 2022.05.12. 16:30 | 0 |
| 2022.05.12. 16:45 | 0 |
| 2022.05.12. 17:00 | 0 |
| 2022.05.12. 17:15 | 0 |
| 2022.05.12. 17:30 | 0 |
| 2022.05.12. 17:45 | 0 |
| 2022.05.12. 18:00 | 0 |
| 2022.05.12. 18:15 | 0 |
| 2022.05.12. 18:30 | 0 |
| 2022.05.12. 18:45 | 0 |
| 2022.05.12. 19:00 | 0 |
| 2022.05.12. 19:15 | 0 |
| 2022.05.12. 19:30 | 0 |
| 2022.05.12. 19:45 | 0 |
| 2022.05.12. 20:00 | 0 |
| 2022.05.12. 20:15 | 0 |
| 2022.05.12. 20:30 | 0 |
| 2022.05.12. 20:45 | 0 |
| 2022.05.12. 21:00 | 0 |
| 2022.05.12. 21:15 | 0 |
| 2022.05.12. 21:30 | 0 |
| 2022.05.12. 21:45 | 0 |
| 2022.05.12. 22:00 | 0 |
| 2022.05.12. 22:15 | 0 |
| 2022.05.12. 22:30 | 0 |
| 2022.05.12. 22:45 | 0 |
| 2022.05.12. 23:00 | 0 |
| 2022.05.12. 23:15 | 0 |
| 2022.05.12. 23:30 | 0 |
| 2022.05.12. 23:45 | 0 |
| 2022.05.13. 00:00 | 0 |
| 2022.05.13. 00:15 | 0 |
| 2022.05.13. 00:30 | 0 |
| 2022.05.13. 00:45 | 0 |
| 2022.05.13. 01:00 | 0 |
| 2022.05.13. 01:15 | 0 |
| 2022.05.13. 01:30 | 0 |
| 2022.05.13. 01:45 | 0 |
| 2022.05.13. 02:00 | 0 |
| 2022.05.13. 02:15 | 0 |
| 2022.05.13. 02:30 | 0 |
| 2022.05.13. 02:45 | 0 |
| 2022.05.13. 03:00 | 0 |
| 2022.05.13. 03:15 | 0 |
| 2022.05.13. 03:30 | 0 |
| 2022.05.13. 03:45 | 0 |
| 2022.05.13. 04:00 | 0 |
| 2022.05.13. 04:15 | 0 |
| 2022.05.13. 04:30 | 0 |
| 2022.05.13. 04:45 | 0 |
| 2022.05.13. 05:00 | 0 |
| 2022.05.13. 05:15 | 0 |
| 2022.05.13. 05:30 | 0 |
| 2022.05.13. 05:45 | 0 |
| 2022.05.13. 06:00 | 0 |
| 2022.05.13. 06:15 | 0 |
| 2022.05.13. 06:30 | 0 |
| 2022.05.13. 06:45 | 0 |
| 2022.05.13. 07:00 | 0 |
| 2022.05.13. 07:15 | 0 |
| 2022.05.13. 07:30 | 0 |
| 2022.05.13. 07:45 | 0 |
| 2022.05.13. 08:00 | 0 |
| 2022.05.13. 08:15 | 0 |
| 2022.05.13. 08:30 | 0 |
| 2022.05.13. 08:45 | 0 |
| 2022.05.13. 09:00 | 0 |
| 2022.05.13. 09:15 | 0 |
| 2022.05.13. 09:30 | 0 |
| 2022.05.13. 09:45 | 0 |
| 2022.05.13. 10:00 | 0 |
| 2022.05.13. 10:15 | 0 |
| 2022.05.13. 10:30 | 0 |
| 2022.05.13. 10:45 | 0 |
| 2022.05.13. 11:00 | 0 |
| 2022.05.13. 11:15 | 0 |
| 2022.05.13. 11:30 | 0 |
| 2022.05.13. 11:45 | 0 |
| 2022.05.13. 12:00 | 0 |
| 2022.05.13. 12:15 | 0 |
| 2022.05.13. 12:30 | 0 |
| 2022.05.13. 12:45 | 0 |
| 2022.05.13. 13:00 | 0 |
| 2022.05.13. 13:15 | 0 |
| 2022.05.13. 13:30 | 0 |
| 2022.05.13. 13:45 | 0 |
| 2022.05.13. 14:00 | 0 |
| 2022.05.13. 14:15 | 0 |
| 2022.05.13. 14:30 | 0 |
| 2022.05.13. 14:45 | 0 |
| 2022.05.13. 15:00 | 0 |
| 2022.05.13. 15:15 | 0 |
| 2022.05.13. 15:30 | 0 |
| 2022.05.13. 15:45 | 0 |
| 2022.05.13. 16:00 | 0 |
| 2022.05.13. 16:15 | 0 |
| 2022.05.13. 16:30 | 0 |
| 2022.05.13. 16:45 | 0 |
| 2022.05.13. 17:00 | 0 |
| 2022.05.13. 17:15 | 0 |
| 2022.05.13. 17:30 | 0 |
| 2022.05.13. 17:45 | 0 |
| 2022.05.13. 18:00 | 0 |
| 2022.05.13. 18:15 | 0 |
| 2022.05.13. 18:30 | 0 |
| 2022.05.13. 18:45 | 0 |
| 2022.05.13. 19:00 | 0 |
| 2022.05.13. 19:15 | 0 |
| 2022.05.13. 19:30 | 0 |
| 2022.05.13. 19:45 | 0 |
| 2022.05.13. 20:00 | 0 |
| 2022.05.13. 20:15 | 0 |
| 2022.05.13. 20:30 | 0 |
| 2022.05.13. 20:45 | 0 |
| 2022.05.13. 21:00 | 0 |
| 2022.05.13. 21:15 | 0 |
| 2022.05.13. 21:30 | 0 |
| 2022.05.13. 21:45 | 0 |
| 2022.05.13. 22:00 | 0 |
| 2022.05.13. 22:15 | 0 |
| 2022.05.13. 22:30 | 0 |
| 2022.05.13. 22:45 | 0 |
| 2022.05.13. 23:00 | 0 |
| 2022.05.13. 23:15 | 0 |
| 2022.05.13. 23:30 | 0 |
| 2022.05.13. 23:45 | 0 |
| 2022.05.14. 00:00 | 0 |
| 2022.05.14. 00:15 | 0 |
| 2022.05.14. 00:30 | 0 |
| 2022.05.14. 00:45 | 0 |
| 2022.05.14. 01:00 | 0 |
| 2022.05.14. 01:15 | 0 |
| 2022.05.14. 01:30 | 0 |
| 2022.05.14. 01:45 | 0 |
| 2022.05.14. 02:00 | 0 |
| 2022.05.14. 02:15 | 0 |
| 2022.05.14. 02:30 | 0 |
| 2022.05.14. 02:45 | 0 |
| 2022.05.14. 03:00 | 0 |
| 2022.05.14. 03:15 | 0 |
| 2022.05.14. 03:30 | 0 |
| 2022.05.14. 03:45 | 0 |
| 2022.05.14. 04:00 | 0 |
| 2022.05.14. 04:15 | 0 |
| 2022.05.14. 04:30 | 0 |
| 2022.05.14. 04:45 | 0 |
| 2022.05.14. 05:00 | 0 |
| 2022.05.14. 05:15 | 0 |
| 2022.05.14. 05:30 | 0 |
| 2022.05.14. 05:45 | 0 |
| 2022.05.14. 06:00 | 0 |
| 2022.05.14. 06:15 | 0 |
| 2022.05.14. 06:30 | 0 |
| 2022.05.14. 06:45 | 0 |
| 2022.05.14. 07:00 | 0 |
| 2022.05.14. 07:15 | 0 |
| 2022.05.14. 07:30 | 0 |
| 2022.05.14. 07:45 | 0 |
| 2022.05.14. 08:00 | 0 |
| 2022.05.14. 08:15 | 0 |
| 2022.05.14. 08:30 | 0 |
| 2022.05.14. 08:45 | 0 |
| 2022.05.14. 09:00 | 0 |
| 2022.05.14. 09:15 | 0 |
| 2022.05.14. 09:30 | 0 |
| 2022.05.14. 09:45 | 0 |
| 2022.05.14. 10:00 | 0 |
| 2022.05.14. 10:15 | 0 |
| 2022.05.14. 10:30 | 0 |
| 2022.05.14. 10:45 | 0 |
| 2022.05.14. 11:00 | 0 |
| 2022.05.14. 11:15 | 0 |
| 2022.05.14. 11:30 | 0 |
| 2022.05.14. 11:45 | 0 |
| 2022.05.14. 12:00 | 0 |
| 2022.05.14. 12:15 | 0 |
| 2022.05.14. 12:30 | 0 |
| 2022.05.14. 12:45 | 0 |
| 2022.05.14. 13:00 | 0 |
| 2022.05.14. 13:15 | 0 |
| 2022.05.14. 13:30 | 0 |
| 2022.05.14. 13:45 | 0 |
| 2022.05.14. 14:00 | 0 |
| 2022.05.14. 14:15 | 0 |
| 2022.05.14. 14:30 | 0 |
| 2022.05.14. 14:45 | 0 |
| 2022.05.14. 15:00 | 0 |
| 2022.05.14. 15:15 | 0 |
| 2022.05.14. 15:30 | 0 |
| 2022.05.14. 15:45 | 0 |
| 2022.05.14. 16:00 | 0 |
| 2022.05.14. 16:15 | 0 |
| 2022.05.14. 16:30 | 0 |
| 2022.05.14. 16:45 | 0 |
| 2022.05.14. 17:00 | 0 |
| 2022.05.14. 17:15 | 0 |
| 2022.05.14. 17:30 | 0 |
| 2022.05.14. 17:45 | 0 |
| 2022.05.14. 18:00 | 0 |
| 2022.05.14. 18:15 | 0 |
| 2022.05.14. 18:30 | 0 |
| 2022.05.14. 18:45 | 0 |
| 2022.05.14. 19:00 | 0 |
| 2022.05.14. 19:15 | 0 |
| 2022.05.14. 19:30 | 0 |
| 2022.05.14. 19:45 | 0 |
| 2022.05.14. 20:00 | 0 |
| 2022.05.14. 20:15 | 0 |
| 2022.05.14. 20:30 | 0 |
| 2022.05.14. 20:45 | 0 |
| 2022.05.14. 21:00 | 0 |
| 2022.05.14. 21:15 | 0 |
| 2022.05.14. 21:30 | 0 |
| 2022.05.14. 21:45 | 0 |
| 2022.05.14. 22:00 | 0 |
| 2022.05.14. 22:15 | 0 |
| 2022.05.14. 22:30 | 0 |
| 2022.05.14. 22:45 | 0 |
| 2022.05.14. 23:00 | 0 |
| 2022.05.14. 23:15 | 0 |
| 2022.05.14. 23:30 | 0 |
| 2022.05.14. 23:45 | 0 |
| 2022.05.15. 00:00 | 0 |
| 2022.05.15. 00:15 | 0 |
| 2022.05.15. 00:30 | 0 |
| 2022.05.15. 00:45 | 0 |
| 2022.05.15. 01:00 | 0 |
| 2022.05.15. 01:15 | 0 |
| 2022.05.15. 01:30 | 0 |
| 2022.05.15. 01:45 | 0 |
| 2022.05.15. 02:00 | 0 |
| 2022.05.15. 02:15 | 0 |
| 2022.05.15. 02:30 | 0 |
| 2022.05.15. 02:45 | 0 |
| 2022.05.15. 03:00 | 0 |
| 2022.05.15. 03:15 | 0 |
| 2022.05.15. 03:30 | 0 |
| 2022.05.15. 03:45 | 0 |
| 2022.05.15. 04:00 | 0 |
| 2022.05.15. 04:15 | 0 |
| 2022.05.15. 04:30 | 0 |
| 2022.05.15. 04:45 | 0 |
| 2022.05.15. 05:00 | 0 |
| 2022.05.15. 05:15 | 0 |
| 2022.05.15. 05:30 | 0 |
| 2022.05.15. 05:45 | 0 |
| 2022.05.15. 06:00 | 0 |
| 2022.05.15. 06:15 | 0 |
| 2022.05.15. 06:30 | 0 |
| 2022.05.15. 06:45 | 0 |
| 2022.05.15. 07:00 | 0 |
| 2022.05.15. 07:15 | 0 |
| 2022.05.15. 07:30 | 0 |
| 2022.05.15. 07:45 | 0 |
| 2022.05.15. 08:00 | 0 |
| 2022.05.15. 08:15 | 0 |
| 2022.05.15. 08:30 | 0 |
| 2022.05.15. 08:45 | 0 |
| 2022.05.15. 09:00 | 0 |
| 2022.05.15. 09:15 | 0 |
| 2022.05.15. 09:30 | 0 |
| 2022.05.15. 09:45 | 0 |
| 2022.05.15. 10:00 | 0 |
| 2022.05.15. 10:15 | 0 |
| 2022.05.15. 10:30 | 0 |
| 2022.05.15. 10:45 | 0 |
| 2022.05.15. 11:00 | 0 |
| 2022.05.15. 11:15 | 0 |
| 2022.05.15. 11:30 | 0 |
| 2022.05.15. 11:45 | 0 |
| 2022.05.15. 12:00 | 0 |
| 2022.05.15. 12:15 | 0 |
| 2022.05.15. 12:30 | 0 |
| 2022.05.15. 12:45 | 0 |
| 2022.05.15. 13:00 | 0 |
| 2022.05.15. 13:15 | 0 |
| 2022.05.15. 13:30 | 0 |
| 2022.05.15. 13:45 | 0 |
| 2022.05.15. 14:00 | 0 |
| 2022.05.15. 14:15 | 0 |
| 2022.05.15. 14:30 | 0 |
| 2022.05.15. 14:45 | 0 |
| 2022.05.15. 15:00 | 0 |
| 2022.05.15. 15:15 | 0 |
| 2022.05.15. 15:30 | 0 |
| 2022.05.15. 15:45 | 0 |
| 2022.05.15. 16:00 | 0 |
| 2022.05.15. 16:15 | 0 |
| 2022.05.15. 16:30 | 0 |
| 2022.05.15. 16:45 | 0 |
| 2022.05.15. 17:00 | 0 |
| 2022.05.15. 17:15 | 0 |
| 2022.05.15. 17:30 | 0 |
| 2022.05.15. 17:45 | 0 |
| 2022.05.15. 18:00 | 0 |
| 2022.05.15. 18:15 | 0 |
| 2022.05.15. 18:30 | 0 |
| 2022.05.15. 18:45 | 0 |
| 2022.05.15. 19:00 | 0 |
| 2022.05.15. 19:15 | 0 |
| 2022.05.15. 19:30 | 0 |
| 2022.05.15. 19:45 | 0 |
| 2022.05.15. 20:00 | 0 |
| 2022.05.15. 20:15 | 0 |
| 2022.05.15. 20:30 | 0 |
| 2022.05.15. 20:45 | 0 |
| 2022.05.15. 21:00 | 0 |
| 2022.05.15. 21:15 | 0 |
| 2022.05.15. 21:30 | 0 |
| 2022.05.15. 21:45 | 0 |
| 2022.05.15. 22:00 | 0 |
| 2022.05.15. 22:15 | 0 |
| 2022.05.15. 22:30 | 0 |
| 2022.05.15. 22:45 | 0 |
| 2022.05.15. 23:00 | 0 |
| 2022.05.15. 23:15 | 0 |
| 2022.05.15. 23:30 | 0 |
| 2022.05.15. 23:45 | 0 |
| 2022.05.16. 00:00 | 0 |
| 2022.05.16. 00:15 | 0 |
| 2022.05.16. 00:30 | 0 |
| 2022.05.16. 00:45 | 0 |
| 2022.05.16. 01:00 | 0 |
| 2022.05.16. 01:15 | 0 |
| 2022.05.16. 01:30 | 0 |
| 2022.05.16. 01:45 | 0 |
| 2022.05.16. 02:00 | 0 |
| 2022.05.16. 02:15 | 0 |
| 2022.05.16. 02:30 | 0 |
| 2022.05.16. 02:45 | 0 |
| 2022.05.16. 03:00 | 0 |
| 2022.05.16. 03:15 | 0 |
| 2022.05.16. 03:30 | 0 |
| 2022.05.16. 03:45 | 0 |
| 2022.05.16. 04:00 | 0 |
| 2022.05.16. 04:15 | 0 |
| 2022.05.16. 04:30 | 0 |
| 2022.05.16. 04:45 | 0 |
| 2022.05.16. 05:00 | 0 |
| 2022.05.16. 05:15 | 0 |
| 2022.05.16. 05:30 | 0 |
| 2022.05.16. 05:45 | 0 |
| 2022.05.16. 06:00 | 0 |
| 2022.05.16. 06:15 | 0 |
| 2022.05.16. 06:30 | 0 |
| 2022.05.16. 06:45 | 0 |
| 2022.05.16. 07:00 | 0 |
| 2022.05.16. 07:15 | 0 |
| 2022.05.16. 07:30 | 0 |
| 2022.05.16. 07:45 | 0 |
| 2022.05.16. 08:00 | 0 |
| 2022.05.16. 08:15 | 0 |
| 2022.05.16. 08:30 | 0 |
| 2022.05.16. 08:45 | 0 |
| 2022.05.16. 09:00 | 0 |
| 2022.05.16. 09:15 | 0 |
| 2022.05.16. 09:30 | 0 |
| 2022.05.16. 09:45 | 0 |
| 2022.05.16. 10:00 | 0 |
| 2022.05.16. 10:15 | 0 |
| 2022.05.16. 10:30 | 0 |
| 2022.05.16. 10:45 | 0 |
| 2022.05.16. 11:00 | 0 |
| 2022.05.16. 11:15 | 0 |
| 2022.05.16. 11:30 | 0 |
| 2022.05.16. 11:45 | 0 |
| 2022.05.16. 12:00 | 0 |
| 2022.05.16. 12:15 | 0 |
| 2022.05.16. 12:30 | 0 |
| 2022.05.16. 12:45 | 0 |
| 2022.05.16. 13:00 | 0 |
| 2022.05.16. 13:15 | 0 |
| 2022.05.16. 13:30 | 0 |
| 2022.05.16. 13:45 | 0 |
| 2022.05.16. 14:00 | 0 |
| 2022.05.16. 14:15 | 0 |
| 2022.05.16. 14:30 | 0 |
| 2022.05.16. 14:45 | 0 |
| 2022.05.16. 15:00 | 0 |
| 2022.05.16. 15:15 | 0 |
| 2022.05.16. 15:30 | 0 |
| 2022.05.16. 15:45 | 0 |
| 2022.05.16. 16:00 | 0 |
| 2022.05.16. 16:15 | 0 |
| 2022.05.16. 16:30 | 0 |
| 2022.05.16. 16:45 | 0 |
| 2022.05.16. 17:00 | 0 |
| 2022.05.16. 17:15 | 0 |
| 2022.05.16. 17:30 | 0 |
| 2022.05.16. 17:45 | 0 |
| 2022.05.16. 18:00 | 0 |
| 2022.05.16. 18:15 | 0 |
| 2022.05.16. 18:30 | 0 |
| 2022.05.16. 18:45 | 0 |
| 2022.05.16. 19:00 | 0 |
| 2022.05.16. 19:15 | 0 |
| 2022.05.16. 19:30 | 0 |
| 2022.05.16. 19:45 | 0 |
| 2022.05.16. 20:00 | 0 |
| 2022.05.16. 20:15 | 0 |
| 2022.05.16. 20:30 | 0 |
| 2022.05.16. 20:45 | 0 |
| 2022.05.16. 21:00 | 0 |
| 2022.05.16. 21:15 | 0 |
| 2022.05.16. 21:30 | 0 |
| 2022.05.16. 21:45 | 0 |
| 2022.05.16. 22:00 | 0 |
| 2022.05.16. 22:15 | 0 |
| 2022.05.16. 22:30 | 0 |
| 2022.05.16. 22:45 | 0 |
| 2022.05.16. 23:00 | 0 |
| 2022.05.16. 23:15 | 0 |
| 2022.05.16. 23:30 | 0 |
| 2022.05.16. 23:45 | 0 |
| 2022.05.17. 00:00 | 0 |
| 2022.05.17. 00:15 | 0 |
| 2022.05.17. 00:30 | 0 |
| 2022.05.17. 00:45 | 0 |
| 2022.05.17. 01:00 | 0 |
| 2022.05.17. 01:15 | 0 |
| 2022.05.17. 01:30 | 0 |
| 2022.05.17. 01:45 | 0 |
| 2022.05.17. 02:00 | 0 |
| 2022.05.17. 02:15 | 0 |
| 2022.05.17. 02:30 | 0 |
| 2022.05.17. 02:45 | 0 |
| 2022.05.17. 03:00 | 0 |
| 2022.05.17. 03:15 | 0 |
| 2022.05.17. 03:30 | 0 |
| 2022.05.17. 03:45 | 0 |
| 2022.05.17. 04:00 | 0 |
| 2022.05.17. 04:15 | 0 |
| 2022.05.17. 04:30 | 0 |
| 2022.05.17. 04:45 | 0 |
| 2022.05.17. 05:00 | 0 |
| 2022.05.17. 05:15 | 0 |
| 2022.05.17. 05:30 | 0 |
| 2022.05.17. 05:45 | 0 |
| 2022.05.17. 06:00 | 0 |
| 2022.05.17. 06:15 | 0 |
| 2022.05.17. 06:30 | 0 |
| 2022.05.17. 06:45 | 0 |
| 2022.05.17. 07:00 | 0 |
| 2022.05.17. 07:15 | 0 |
| 2022.05.17. 07:30 | 0 |
| 2022.05.17. 07:45 | 0 |
| 2022.05.17. 08:00 | 0 |
| 2022.05.17. 08:15 | 0 |
| 2022.05.17. 08:30 | 0 |
| 2022.05.17. 08:45 | 0 |
| 2022.05.17. 09:00 | 0 |
| 2022.05.17. 09:15 | 0 |
| 2022.05.17. 09:30 | 0 |
| 2022.05.17. 09:45 | 0 |
| 2022.05.17. 10:00 | 0 |
| 2022.05.17. 10:15 | 0 |
| 2022.05.17. 10:30 | 0 |
| 2022.05.17. 10:45 | 0 |
| 2022.05.17. 11:00 | 0 |
| 2022.05.17. 11:15 | 0 |
| 2022.05.17. 11:30 | 0 |
| 2022.05.17. 11:45 | 0 |
| 2022.05.17. 12:00 | 0 |
| 2022.05.17. 12:15 | 0 |
| 2022.05.17. 12:30 | 0 |
| 2022.05.17. 12:45 | 0 |
| 2022.05.17. 13:00 | 0 |
| 2022.05.17. 13:15 | 0 |
| 2022.05.17. 13:30 | 0 |
| 2022.05.17. 13:45 | 0 |
| 2022.05.17. 14:00 | 0 |
| 2022.05.17. 14:15 | 0 |
| 2022.05.17. 14:30 | 0 |
| 2022.05.17. 14:45 | 0 |
| 2022.05.17. 15:00 | 0 |
| 2022.05.17. 15:15 | 0 |
| 2022.05.17. 15:30 | 0 |
| 2022.05.17. 15:45 | 0 |
| 2022.05.17. 16:00 | 0 |
| 2022.05.17. 16:15 | 0 |
| 2022.05.17. 16:30 | 0 |
| 2022.05.17. 16:45 | 0 |
| 2022.05.17. 17:00 | 0 |
| 2022.05.17. 17:15 | 0 |
| 2022.05.17. 17:30 | 0 |
| 2022.05.17. 17:45 | 0 |
| 2022.05.17. 18:00 | 0 |
| 2022.05.17. 18:15 | 0 |
| 2022.05.17. 18:30 | 0 |
| 2022.05.17. 18:45 | 0 |
| 2022.05.17. 19:00 | 0 |
| 2022.05.17. 19:15 | 0 |
| 2022.05.17. 19:30 | 0 |
| 2022.05.17. 19:45 | 0 |
| 2022.05.17. 20:00 | 0 |
| 2022.05.17. 20:15 | 0 |
| 2022.05.17. 20:30 | 0 |
| 2022.05.17. 20:45 | 0 |
| 2022.05.17. 21:00 | 0 |
| 2022.05.17. 21:15 | 0 |
| 2022.05.17. 21:30 | 0 |
| 2022.05.17. 21:45 | 0 |
| 2022.05.17. 22:00 | 0 |
| 2022.05.17. 22:15 | 0 |
| 2022.05.17. 22:30 | 0 |
| 2022.05.17. 22:45 | 0 |
| 2022.05.17. 23:00 | 0 |
| 2022.05.17. 23:15 | 0 |
| 2022.05.17. 23:30 | 0 |
| 2022.05.17. 23:45 | 0 |
| 2022.05.18. 00:00 | 0 |
| 2022.05.18. 00:15 | 0 |
| 2022.05.18. 00:30 | 0 |
| 2022.05.18. 00:45 | 0 |
| 2022.05.18. 01:00 | 0 |
| 2022.05.18. 01:15 | 0 |
| 2022.05.18. 01:30 | 0 |
| 2022.05.18. 01:45 | 0 |
| 2022.05.18. 02:00 | 0 |
| 2022.05.18. 02:15 | 0 |
| 2022.05.18. 02:30 | 0 |
| 2022.05.18. 02:45 | 0 |
| 2022.05.18. 03:00 | 0 |
| 2022.05.18. 03:15 | 0 |
| 2022.05.18. 03:30 | 0 |
| 2022.05.18. 03:45 | 0 |
| 2022.05.18. 04:00 | 0 |
| 2022.05.18. 04:15 | 0 |
| 2022.05.18. 04:30 | 0 |
| 2022.05.18. 04:45 | 0 |
| 2022.05.18. 05:00 | 0 |
| 2022.05.18. 05:15 | 0 |
| 2022.05.18. 05:30 | 0 |
| 2022.05.18. 05:45 | 0 |
| 2022.05.18. 06:00 | 0 |
| 2022.05.18. 06:15 | 0 |
| 2022.05.18. 06:30 | 0 |
| 2022.05.18. 06:45 | 0 |
| 2022.05.18. 07:00 | 0 |
| 2022.05.18. 07:15 | 0 |
| 2022.05.18. 07:30 | 0 |
| 2022.05.18. 07:45 | 0 |
| 2022.05.18. 08:00 | 0 |
| 2022.05.18. 08:15 | 0 |
| 2022.05.18. 08:30 | 0 |
| 2022.05.18. 08:45 | 0 |
| 2022.05.18. 09:00 | 0 |
| 2022.05.18. 09:15 | 0 |
| 2022.05.18. 09:30 | 0 |
| 2022.05.18. 09:45 | 0 |
| 2022.05.18. 10:00 | 0 |
| 2022.05.18. 10:15 | 0 |
| 2022.05.18. 10:30 | 0 |
| 2022.05.18. 10:45 | 0 |
| 2022.05.18. 11:00 | 0 |
| 2022.05.18. 11:15 | 0 |
| 2022.05.18. 11:30 | 0 |
| 2022.05.18. 11:45 | 0 |
| 2022.05.18. 12:00 | 0 |
| 2022.05.18. 12:15 | 0 |
| 2022.05.18. 12:30 | 0 |
| 2022.05.18. 12:45 | 0 |
| 2022.05.18. 13:00 | 0 |
| 2022.05.18. 13:15 | 0 |
| 2022.05.18. 13:30 | 0 |
| 2022.05.18. 13:45 | 0 |
| 2022.05.18. 14:00 | 0 |
| 2022.05.18. 14:15 | 0 |
| 2022.05.18. 14:30 | 0 |
| 2022.05.18. 14:45 | 0 |
| 2022.05.18. 15:00 | 0 |
| 2022.05.18. 15:15 | 0 |
| 2022.05.18. 15:30 | 0 |
| 2022.05.18. 15:45 | 0 |
| 2022.05.18. 16:00 | 0 |
| 2022.05.18. 16:15 | 0 |
| 2022.05.18. 16:30 | 0 |
| 2022.05.18. 16:45 | 0 |
| 2022.05.18. 17:00 | 0 |
| 2022.05.18. 17:15 | 0 |
| 2022.05.18. 17:30 | 0 |
| 2022.05.18. 17:45 | 0 |
| 2022.05.18. 18:00 | 0 |
| 2022.05.18. 18:15 | 0 |
| 2022.05.18. 18:30 | 0 |
| 2022.05.18. 18:45 | 0 |
| 2022.05.18. 19:00 | 0 |
| 2022.05.18. 19:15 | 0 |
| 2022.05.18. 19:30 | 0 |
| 2022.05.18. 19:45 | 0 |
| 2022.05.18. 20:00 | 0 |
| 2022.05.18. 20:15 | 0 |
| 2022.05.18. 20:30 | 0 |
| 2022.05.18. 20:45 | 0 |
| 2022.05.18. 21:00 | 0 |
| 2022.05.18. 21:15 | 0 |
| 2022.05.18. 21:30 | 0 |
| 2022.05.18. 21:45 | 0 |
| 2022.05.18. 22:00 | 0 |
| 2022.05.18. 22:15 | 0 |
| 2022.05.18. 22:30 | 0 |
| 2022.05.18. 22:45 | 0 |
| 2022.05.18. 23:00 | 0 |
| 2022.05.18. 23:15 | 0 |
| 2022.05.18. 23:30 | 0 |
| 2022.05.18. 23:45 | 0 |
| 2022.05.19. 00:00 | 0 |
| 2022.05.19. 00:15 | 0 |
| 2022.05.19. 00:30 | 0 |
| 2022.05.19. 00:45 | 0 |
| 2022.05.19. 01:00 | 0 |
| 2022.05.19. 01:15 | 0 |
| 2022.05.19. 01:30 | 0 |
| 2022.05.19. 01:45 | 0 |
| 2022.05.19. 02:00 | 0 |
| 2022.05.19. 02:15 | 0 |
| 2022.05.19. 02:30 | 0 |
| 2022.05.19. 02:45 | 0 |
| 2022.05.19. 03:00 | 0 |
| 2022.05.19. 03:15 | 0 |
| 2022.05.19. 03:30 | 0 |
| 2022.05.19. 03:45 | 0 |
| 2022.05.19. 04:00 | 0 |
| 2022.05.19. 04:15 | 0 |
| 2022.05.19. 04:30 | 0 |
| 2022.05.19. 04:45 | 0 |
| 2022.05.19. 05:00 | 0 |
| 2022.05.19. 05:15 | 0 |
| 2022.05.19. 05:30 | 0 |
| 2022.05.19. 05:45 | 0 |
| 2022.05.19. 06:00 | 0 |
| 2022.05.19. 06:15 | 0 |
| 2022.05.19. 06:30 | 0 |
| 2022.05.19. 06:45 | 0 |
| 2022.05.19. 07:00 | 0 |
| 2022.05.19. 07:15 | 0 |
| 2022.05.19. 07:30 | 0 |
| 2022.05.19. 07:45 | 0 |
| 2022.05.19. 08:00 | 0 |
| 2022.05.19. 08:15 | 0 |
| 2022.05.19. 08:30 | 0 |
| 2022.05.19. 08:45 | 0 |
| 2022.05.19. 09:00 | 0 |
| 2022.05.19. 09:15 | 0 |
| 2022.05.19. 09:30 | 0 |
| 2022.05.19. 09:45 | 0 |
| 2022.05.19. 10:00 | 0 |
| 2022.05.19. 10:15 | 0 |
| 2022.05.19. 10:30 | 0 |
| 2022.05.19. 10:45 | 0 |
| 2022.05.19. 11:00 | 0 |
| 2022.05.19. 11:15 | 0 |
| 2022.05.19. 11:30 | 0 |
| 2022.05.19. 11:45 | 0 |
| 2022.05.19. 12:00 | 0 |
| 2022.05.19. 12:15 | 0 |
| 2022.05.19. 12:30 | 0 |
| 2022.05.19. 12:45 | 0 |
| 2022.05.19. 13:00 | 0 |
| 2022.05.19. 13:15 | 0 |
| 2022.05.19. 13:30 | 0 |
| 2022.05.19. 13:45 | 0 |
| 2022.05.19. 14:00 | 0 |
| 2022.05.19. 14:15 | 0 |
| 2022.05.19. 14:30 | 0 |
| 2022.05.19. 14:45 | 0 |
| 2022.05.19. 15:00 | 0 |
| 2022.05.19. 15:15 | 0 |
| 2022.05.19. 15:30 | 0 |
| 2022.05.19. 15:45 | 0 |
| 2022.05.19. 16:00 | 0 |
| 2022.05.19. 16:15 | 0 |
| 2022.05.19. 16:30 | 0 |
| 2022.05.19. 16:45 | 0 |
| 2022.05.19. 17:00 | 0 |
| 2022.05.19. 17:15 | 0 |
| 2022.05.19. 17:30 | 0 |
| 2022.05.19. 17:45 | 0 |
| 2022.05.19. 18:00 | 0 |
| 2022.05.19. 18:15 | 0 |
| 2022.05.19. 18:30 | 0 |
| 2022.05.19. 18:45 | 0 |
| 2022.05.19. 19:00 | 0 |
| 2022.05.19. 19:15 | 0 |
| 2022.05.19. 19:30 | 0 |
| 2022.05.19. 19:45 | 0 |
| 2022.05.19. 20:00 | 0 |
| 2022.05.19. 20:15 | 0 |
| 2022.05.19. 20:30 | 0 |
| 2022.05.19. 20:45 | 0 |
| 2022.05.19. 21:00 | 0 |
| 2022.05.19. 21:15 | 0 |
| 2022.05.19. 21:30 | 0 |
| 2022.05.19. 21:45 | 0 |
| 2022.05.19. 22:00 | 0 |
| 2022.05.19. 22:15 | 0 |
| 2022.05.19. 22:30 | 0 |
| 2022.05.19. 22:45 | 0 |
| 2022.05.19. 23:00 | 0 |
| 2022.05.19. 23:15 | 0 |
| 2022.05.19. 23:30 | 0 |
| 2022.05.19. 23:45 | 0 |
| 2022.05.20. 00:00 | 0 |
| 2022.05.20. 00:15 | 0 |
| 2022.05.20. 00:30 | 0 |
| 2022.05.20. 00:45 | 0 |
| 2022.05.20. 01:00 | 0 |
| 2022.05.20. 01:15 | 0 |
| 2022.05.20. 01:30 | 0 |
| 2022.05.20. 01:45 | 0 |
| 2022.05.20. 02:00 | 0 |
| 2022.05.20. 02:15 | 0 |
| 2022.05.20. 02:30 | 0 |
| 2022.05.20. 02:45 | 0 |
| 2022.05.20. 03:00 | 0 |
| 2022.05.20. 03:15 | 0 |
| 2022.05.20. 03:30 | 0 |
| 2022.05.20. 03:45 | 0 |
| 2022.05.20. 04:00 | 0 |
| 2022.05.20. 04:15 | 0 |
| 2022.05.20. 04:30 | 0 |
| 2022.05.20. 04:45 | 0 |
| 2022.05.20. 05:00 | 0 |
| 2022.05.20. 05:15 | 0 |
| 2022.05.20. 05:30 | 0 |
| 2022.05.20. 05:45 | 0 |
| 2022.05.20. 06:00 | 0 |
| 2022.05.20. 06:15 | 0 |
| 2022.05.20. 06:30 | 0 |
| 2022.05.20. 06:45 | 0 |
| 2022.05.20. 07:00 | 0 |
| 2022.05.20. 07:15 | 0 |
| 2022.05.20. 07:30 | 0 |
| 2022.05.20. 07:45 | 0 |
| 2022.05.20. 08:00 | 0 |
| 2022.05.20. 08:15 | 0 |
| 2022.05.20. 08:30 | 0 |
| 2022.05.20. 08:45 | 0 |
| 2022.05.20. 09:00 | 0 |
| 2022.05.20. 09:15 | 0 |
| 2022.05.20. 09:30 | 0 |
| 2022.05.20. 09:45 | 0 |
| 2022.05.20. 10:00 | 0 |
| 2022.05.20. 10:15 | 0 |
| 2022.05.20. 10:30 | 0 |
| 2022.05.20. 10:45 | 0 |
| 2022.05.20. 11:00 | 0 |
| 2022.05.20. 11:15 | 0 |
| 2022.05.20. 11:30 | 0 |
| 2022.05.20. 11:45 | 0 |
| 2022.05.20. 12:00 | 0 |
| 2022.05.20. 12:15 | 0 |
| 2022.05.20. 12:30 | 0 |
| 2022.05.20. 12:45 | 0 |
| 2022.05.20. 13:00 | 0 |
| 2022.05.20. 13:15 | 0 |
| 2022.05.20. 13:30 | 0 |
| 2022.05.20. 13:45 | 0 |
| 2022.05.20. 14:00 | 0 |
| 2022.05.20. 14:15 | 0 |
| 2022.05.20. 14:30 | 0 |
| 2022.05.20. 14:45 | 0 |
| 2022.05.20. 15:00 | 0 |
| 2022.05.20. 15:15 | 0 |
| 2022.05.20. 15:30 | 0 |
| 2022.05.20. 15:45 | 0 |
| 2022.05.20. 16:00 | 0 |
| 2022.05.20. 16:15 | 0 |
| 2022.05.20. 16:30 | 0 |
| 2022.05.20. 16:45 | 0 |
| 2022.05.20. 17:00 | 0 |
| 2022.05.20. 17:15 | 0 |
| 2022.05.20. 17:30 | 0 |
| 2022.05.20. 17:45 | 0 |
| 2022.05.20. 18:00 | 0 |
| 2022.05.20. 18:15 | 0 |
| 2022.05.20. 18:30 | 0 |
| 2022.05.20. 18:45 | 0 |
| 2022.05.20. 19:00 | 0 |
| 2022.05.20. 19:15 | 0 |
| 2022.05.20. 19:30 | 0 |
| 2022.05.20. 19:45 | 0 |
| 2022.05.20. 20:00 | 0 |
| 2022.05.20. 20:15 | 0 |
| 2022.05.20. 20:30 | 0 |
| 2022.05.20. 20:45 | 0 |
| 2022.05.20. 21:00 | 0 |
| 2022.05.20. 21:15 | 0 |
| 2022.05.20. 21:30 | 0 |
| 2022.05.20. 21:45 | 0 |
| 2022.05.20. 22:00 | 0 |
| 2022.05.20. 22:15 | 0 |
| 2022.05.20. 22:30 | 0 |
| 2022.05.20. 22:45 | 0 |
| 2022.05.20. 23:00 | 0 |
| 2022.05.20. 23:15 | 0 |
| 2022.05.20. 23:30 | 0 |
| 2022.05.20. 23:45 | 0 |
| 2022.05.21. 00:00 | 0 |
| 2022.05.21. 00:15 | 0 |
| 2022.05.21. 00:30 | 0 |
| 2022.05.21. 00:45 | 0 |
| 2022.05.21. 01:00 | 0 |
| 2022.05.21. 01:15 | 0 |
| 2022.05.21. 01:30 | 0 |
| 2022.05.21. 01:45 | 0 |
| 2022.05.21. 02:00 | 0 |
| 2022.05.21. 02:15 | 0 |
| 2022.05.21. 02:30 | 0 |
| 2022.05.21. 02:45 | 0 |
| 2022.05.21. 03:00 | 0 |
| 2022.05.21. 03:15 | 0 |
| 2022.05.21. 03:30 | 0 |
| 2022.05.21. 03:45 | 0 |
| 2022.05.21. 04:00 | 0 |
| 2022.05.21. 04:15 | 0 |
| 2022.05.21. 04:30 | 0 |
| 2022.05.21. 04:45 | 0 |
| 2022.05.21. 05:00 | 0 |
| 2022.05.21. 05:15 | 0 |
| 2022.05.21. 05:30 | 0 |
| 2022.05.21. 05:45 | 0 |
| 2022.05.21. 06:00 | 0 |
| 2022.05.21. 06:15 | 0 |
| 2022.05.21. 06:30 | 0 |
| 2022.05.21. 06:45 | 0 |
| 2022.05.21. 07:00 | 0 |
| 2022.05.21. 07:15 | 0 |
| 2022.05.21. 07:30 | 0 |
| 2022.05.21. 07:45 | 0 |
| 2022.05.21. 08:00 | 0 |
| 2022.05.21. 08:15 | 0 |
| 2022.05.21. 08:30 | 0 |
| 2022.05.21. 08:45 | 0 |
| 2022.05.21. 09:00 | 0 |
| 2022.05.21. 09:15 | 0 |
| 2022.05.21. 09:30 | 0 |
| 2022.05.21. 09:45 | 0 |
| 2022.05.21. 10:00 | 0 |
| 2022.05.21. 10:15 | 0 |
| 2022.05.21. 10:30 | 0 |
| 2022.05.21. 10:45 | 0 |
| 2022.05.21. 11:00 | 0 |
| 2022.05.21. 11:15 | 0 |
| 2022.05.21. 11:30 | 0 |
| 2022.05.21. 11:45 | 0 |
| 2022.05.21. 12:00 | 0 |
| 2022.05.21. 12:15 | 0 |
| 2022.05.21. 12:30 | 0 |
| 2022.05.21. 12:45 | 0 |
| 2022.05.21. 13:00 | 0 |
| 2022.05.21. 13:15 | 0 |
| 2022.05.21. 13:30 | 0 |
| 2022.05.21. 13:45 | 0 |
| 2022.05.21. 14:00 | 0 |
| 2022.05.21. 14:15 | 0 |
| 2022.05.21. 14:30 | 0 |
| 2022.05.21. 14:45 | 0 |
| 2022.05.21. 15:00 | 0 |
| 2022.05.21. 15:15 | 0 |
| 2022.05.21. 15:30 | 0 |
| 2022.05.21. 15:45 | 0 |
| 2022.05.21. 16:00 | 0 |
| 2022.05.21. 16:15 | 0 |
| 2022.05.21. 16:30 | 0 |
| 2022.05.21. 16:45 | 0 |
| 2022.05.21. 17:00 | 0 |
| 2022.05.21. 17:15 | 0 |
| 2022.05.21. 17:30 | 0 |
| 2022.05.21. 17:45 | 0 |
| 2022.05.21. 18:00 | 0 |
| 2022.05.21. 18:15 | 0 |
| 2022.05.21. 18:30 | 0 |
| 2022.05.21. 18:45 | 0 |
| 2022.05.21. 19:00 | 0 |
| 2022.05.21. 19:15 | 0 |
| 2022.05.21. 19:30 | 0 |
| 2022.05.21. 19:45 | 0 |
| 2022.05.21. 20:00 | 0 |
| 2022.05.21. 20:15 | 0 |
| 2022.05.21. 20:30 | 0 |
| 2022.05.21. 20:45 | 0 |
| 2022.05.21. 21:00 | 0 |
| 2022.05.21. 21:15 | 0 |
| 2022.05.21. 21:30 | 0 |
| 2022.05.21. 21:45 | 0 |
| 2022.05.21. 22:00 | 0 |
| 2022.05.21. 22:15 | 0 |
| 2022.05.21. 22:30 | 0 |
| 2022.05.21. 22:45 | 0 |
| 2022.05.21. 23:00 | 0 |
| 2022.05.21. 23:15 | 0 |
| 2022.05.21. 23:30 | 0 |
| 2022.05.21. 23:45 | 0 |
| 2022.05.22. 00:00 | 0 |
| 2022.05.22. 00:15 | 0 |
| 2022.05.22. 00:30 | 0 |
| 2022.05.22. 00:45 | 0 |
| 2022.05.22. 01:00 | 0 |
| 2022.05.22. 01:15 | 0 |
| 2022.05.22. 01:30 | 0 |
| 2022.05.22. 01:45 | 0 |
| 2022.05.22. 02:00 | 0 |
| 2022.05.22. 02:15 | 0 |
| 2022.05.22. 02:30 | 0 |
| 2022.05.22. 02:45 | 0 |
| 2022.05.22. 03:00 | 0 |
| 2022.05.22. 03:15 | 0 |
| 2022.05.22. 03:30 | 0 |
| 2022.05.22. 03:45 | 0 |
| 2022.05.22. 04:00 | 0 |
| 2022.05.22. 04:15 | 0 |
| 2022.05.22. 04:30 | 0 |
| 2022.05.22. 04:45 | 0 |
| 2022.05.22. 05:00 | 0 |
| 2022.05.22. 05:15 | 0 |
| 2022.05.22. 05:30 | 0 |
| 2022.05.22. 05:45 | 0 |
| 2022.05.22. 06:00 | 0 |
| 2022.05.22. 06:15 | 0 |
| 2022.05.22. 06:30 | 0 |
| 2022.05.22. 06:45 | 0 |
| 2022.05.22. 07:00 | 0 |
| 2022.05.22. 07:15 | 0 |
| 2022.05.22. 07:30 | 0 |
| 2022.05.22. 07:45 | 0 |
| 2022.05.22. 08:00 | 0 |
| 2022.05.22. 08:15 | 0 |
| 2022.05.22. 08:30 | 0 |
| 2022.05.22. 08:45 | 0 |
| 2022.05.22. 09:00 | 0 |
| 2022.05.22. 09:15 | 0 |
| 2022.05.22. 09:30 | 0 |
| 2022.05.22. 09:45 | 0 |
| 2022.05.22. 10:00 | 0 |
| 2022.05.22. 10:15 | 0 |
| 2022.05.22. 10:30 | 0 |
| 2022.05.22. 10:45 | 0 |
| 2022.05.22. 11:00 | 0 |
| 2022.05.22. 11:15 | 0 |
| 2022.05.22. 11:30 | 0 |
| 2022.05.22. 11:45 | 0 |
| 2022.05.22. 12:00 | 0 |
| 2022.05.22. 12:15 | 0 |
| 2022.05.22. 12:30 | 0 |
| 2022.05.22. 12:45 | 0 |
| 2022.05.22. 13:00 | 0 |
| 2022.05.22. 13:15 | 0 |
| 2022.05.22. 13:30 | 0 |
| 2022.05.22. 13:45 | 0 |
| 2022.05.22. 14:00 | 0 |
| 2022.05.22. 14:15 | 0 |
| 2022.05.22. 14:30 | 0 |
| 2022.05.22. 14:45 | 0 |
| 2022.05.22. 15:00 | 0 |
| 2022.05.22. 15:15 | 0 |
| 2022.05.22. 15:30 | 0 |
| 2022.05.22. 15:45 | 0 |
| 2022.05.22. 16:00 | 0 |
| 2022.05.22. 16:15 | 0 |
| 2022.05.22. 16:30 | 0 |
| 2022.05.22. 16:45 | 0 |
| 2022.05.22. 17:00 | 0 |
| 2022.05.22. 17:15 | 0 |
| 2022.05.22. 17:30 | 0 |
| 2022.05.22. 17:45 | 0 |
| 2022.05.22. 18:00 | 0 |
| 2022.05.22. 18:15 | 0 |
| 2022.05.22. 18:30 | 0 |
| 2022.05.22. 18:45 | 0 |
| 2022.05.22. 19:00 | 0 |
| 2022.05.22. 19:15 | 0 |
| 2022.05.22. 19:30 | 0 |
| 2022.05.22. 19:45 | 0 |
| 2022.05.22. 20:00 | 0 |
| 2022.05.22. 20:15 | 0 |
| 2022.05.22. 20:30 | 0 |
| 2022.05.22. 20:45 | 0 |
| 2022.05.22. 21:00 | 0 |
| 2022.05.22. 21:15 | 0 |
| 2022.05.22. 21:30 | 0 |
| 2022.05.22. 21:45 | 0 |
| 2022.05.22. 22:00 | 0 |
| 2022.05.22. 22:15 | 0 |
| 2022.05.22. 22:30 | 0 |
| 2022.05.22. 22:45 | 0 |
| 2022.05.22. 23:00 | 0 |
| 2022.05.22. 23:15 | 0 |
| 2022.05.22. 23:30 | 0 |
| 2022.05.22. 23:45 | 0 |
| 2022.05.23. 00:00 | 0 |
| 2022.05.23. 00:15 | 0 |
| 2022.05.23. 00:30 | 0 |
| 2022.05.23. 00:45 | 0 |
| 2022.05.23. 01:00 | 0 |
| 2022.05.23. 01:15 | 0 |
| 2022.05.23. 01:30 | 0 |
| 2022.05.23. 01:45 | 0 |
| 2022.05.23. 02:00 | 0 |
| 2022.05.23. 02:15 | 0 |
| 2022.05.23. 02:30 | 0 |
| 2022.05.23. 02:45 | 0 |
| 2022.05.23. 03:00 | 0 |
| 2022.05.23. 03:15 | 0 |
| 2022.05.23. 03:30 | 0 |
| 2022.05.23. 03:45 | 0 |
| 2022.05.23. 04:00 | 0 |
| 2022.05.23. 04:15 | 0 |
| 2022.05.23. 04:30 | 0 |
| 2022.05.23. 04:45 | 0 |
| 2022.05.23. 05:00 | 0 |
| 2022.05.23. 05:15 | 0 |
| 2022.05.23. 05:30 | 0 |
| 2022.05.23. 05:45 | 0 |
| 2022.05.23. 06:00 | 0 |
| 2022.05.23. 06:15 | 0 |
| 2022.05.23. 06:30 | 0 |
| 2022.05.23. 06:45 | 0 |
| 2022.05.23. 07:00 | 0 |
| 2022.05.23. 07:15 | 0 |
| 2022.05.23. 07:30 | 0 |
| 2022.05.23. 07:45 | 0 |
| 2022.05.23. 08:00 | 0 |
| 2022.05.23. 08:15 | 0 |
| 2022.05.23. 08:30 | 0 |
| 2022.05.23. 08:45 | 0 |
| 2022.05.23. 09:00 | 0 |
| 2022.05.23. 09:15 | 0 |
| 2022.05.23. 09:30 | 0 |
| 2022.05.23. 09:45 | 0 |
| 2022.05.23. 10:00 | 0 |
| 2022.05.23. 10:15 | 0 |
| 2022.05.23. 10:30 | 0 |
| 2022.05.23. 10:45 | 0 |
| 2022.05.23. 11:00 | 0 |
| 2022.05.23. 11:15 | 0 |
| 2022.05.23. 11:30 | 0 |
| 2022.05.23. 11:45 | 0 |
| 2022.05.23. 12:00 | 0 |
| 2022.05.23. 12:15 | 0 |
| 2022.05.23. 12:30 | 0 |
| 2022.05.23. 12:45 | 0 |
| 2022.05.23. 13:00 | 0 |
| 2022.05.23. 13:15 | 0 |
| 2022.05.23. 13:30 | 0 |
| 2022.05.23. 13:45 | 0 |
| 2022.05.23. 14:00 | 0 |
| 2022.05.23. 14:15 | 0 |
| 2022.05.23. 14:30 | 0 |
| 2022.05.23. 14:45 | 0 |
| 2022.05.23. 15:00 | 0 |
| 2022.05.23. 15:15 | 0 |
| 2022.05.23. 15:30 | 0 |
| 2022.05.23. 15:45 | 0 |
| 2022.05.23. 16:00 | 0 |
| 2022.05.23. 16:15 | 0 |
| 2022.05.23. 16:30 | 0 |
| 2022.05.23. 16:45 | 0 |
| 2022.05.23. 17:00 | 0 |
| 2022.05.23. 17:15 | 0 |
| 2022.05.23. 17:30 | 0 |
| 2022.05.23. 17:45 | 0 |
| 2022.05.23. 18:00 | 0 |
| 2022.05.23. 18:15 | 0 |
| 2022.05.23. 18:30 | 0 |
| 2022.05.23. 18:45 | 0 |
| 2022.05.23. 19:00 | 0 |
| 2022.05.23. 19:15 | 0 |
| 2022.05.23. 19:30 | 0 |
| 2022.05.23. 19:45 | 0 |
| 2022.05.23. 20:00 | 0 |
| 2022.05.23. 20:15 | 0 |
| 2022.05.23. 20:30 | 0 |
| 2022.05.23. 20:45 | 0 |
| 2022.05.23. 21:00 | 0 |
| 2022.05.23. 21:15 | 0 |
| 2022.05.23. 21:30 | 0 |
| 2022.05.23. 21:45 | 0 |
| 2022.05.23. 22:00 | 0 |
| 2022.05.23. 22:15 | 0 |
| 2022.05.23. 22:30 | 0 |
| 2022.05.23. 22:45 | 0 |
| 2022.05.23. 23:00 | 0 |
| 2022.05.23. 23:15 | 0 |
| 2022.05.23. 23:30 | 0 |
| 2022.05.23. 23:45 | 0 |
| 2022.05.24. 00:00 | 0 |
| 2022.05.24. 00:15 | 0 |
| 2022.05.24. 00:30 | 0 |
| 2022.05.24. 00:45 | 0 |
| 2022.05.24. 01:00 | 0 |
| 2022.05.24. 01:15 | 0 |
| 2022.05.24. 01:30 | 0 |
| 2022.05.24. 01:45 | 0 |
| 2022.05.24. 02:00 | 0 |
| 2022.05.24. 02:15 | 0 |
| 2022.05.24. 02:30 | 0 |
| 2022.05.24. 02:45 | 0 |
| 2022.05.24. 03:00 | 0 |
| 2022.05.24. 03:15 | 0 |
| 2022.05.24. 03:30 | 0 |
| 2022.05.24. 03:45 | 0 |
| 2022.05.24. 04:00 | 0 |
| 2022.05.24. 04:15 | 0 |
| 2022.05.24. 04:30 | 0 |
| 2022.05.24. 04:45 | 0 |
| 2022.05.24. 05:00 | 0 |
| 2022.05.24. 05:15 | 0 |
| 2022.05.24. 05:30 | 0 |
| 2022.05.24. 05:45 | 0 |
| 2022.05.24. 06:00 | 0 |
| 2022.05.24. 06:15 | 0 |
| 2022.05.24. 06:30 | 0 |
| 2022.05.24. 06:45 | 0 |
| 2022.05.24. 07:00 | 0 |
| 2022.05.24. 07:15 | 0 |
| 2022.05.24. 07:30 | 0 |
| 2022.05.24. 07:45 | 0 |
| 2022.05.24. 08:00 | 0 |
| 2022.05.24. 08:15 | 0 |
| 2022.05.24. 08:30 | 0 |
| 2022.05.24. 08:45 | 0 |
| 2022.05.24. 09:00 | 0 |
| 2022.05.24. 09:15 | 0 |
| 2022.05.24. 09:30 | 0 |
| 2022.05.24. 09:45 | 0 |
| 2022.05.24. 10:00 | 0 |
| 2022.05.24. 10:15 | 0 |
| 2022.05.24. 10:30 | 0 |
| 2022.05.24. 10:45 | 0 |
| 2022.05.24. 11:00 | 0 |
| 2022.05.24. 11:15 | 0 |
| 2022.05.24. 11:30 | 0 |
| 2022.05.24. 11:45 | 0 |
| 2022.05.24. 12:00 | 0 |
| 2022.05.24. 12:15 | 0 |
| 2022.05.24. 12:30 | 0 |
| 2022.05.24. 12:45 | 0 |
| 2022.05.24. 13:00 | 0 |
| 2022.05.24. 13:15 | 0 |
| 2022.05.24. 13:30 | 0 |
| 2022.05.24. 13:45 | 0 |
| 2022.05.24. 14:00 | 0 |
| 2022.05.24. 14:15 | 0 |
| 2022.05.24. 14:30 | 0 |
| 2022.05.24. 14:45 | 0 |
| 2022.05.24. 15:00 | 0 |
| 2022.05.24. 15:15 | 0 |
| 2022.05.24. 15:30 | 0 |
| 2022.05.24. 15:45 | 0 |
| 2022.05.24. 16:00 | 0 |
| 2022.05.24. 16:15 | 0 |
| 2022.05.24. 16:30 | 0 |
| 2022.05.24. 16:45 | 0 |
| 2022.05.24. 17:00 | 0 |
| 2022.05.24. 17:15 | 0 |
| 2022.05.24. 17:30 | 0 |
| 2022.05.24. 17:45 | 0 |
| 2022.05.24. 18:00 | 0 |
| 2022.05.24. 18:15 | 0 |
| 2022.05.24. 18:30 | 0 |
| 2022.05.24. 18:45 | 0 |
| 2022.05.24. 19:00 | 0 |
| 2022.05.24. 19:15 | 0 |
| 2022.05.24. 19:30 | 0 |
| 2022.05.24. 19:45 | 0 |
| 2022.05.24. 20:00 | 0 |
| 2022.05.24. 20:15 | 0 |
| 2022.05.24. 20:30 | 0 |
| 2022.05.24. 20:45 | 0 |
| 2022.05.24. 21:00 | 0 |
| 2022.05.24. 21:15 | 0 |
| 2022.05.24. 21:30 | 0 |
| 2022.05.24. 21:45 | 0 |
| 2022.05.24. 22:00 | 0 |
| 2022.05.24. 22:15 | 0 |
| 2022.05.24. 22:30 | 0 |
| 2022.05.24. 22:45 | 0 |
| 2022.05.24. 23:00 | 0 |
| 2022.05.24. 23:15 | 0 |
| 2022.05.24. 23:30 | 0 |
| 2022.05.24. 23:45 | 0 |
| 2022.05.25. 00:00 | 0 |
| 2022.05.25. 00:15 | 0 |
| 2022.05.25. 00:30 | 0 |
| 2022.05.25. 00:45 | 0 |
| 2022.05.25. 01:00 | 0 |
| 2022.05.25. 01:15 | 0 |
| 2022.05.25. 01:30 | 0 |
| 2022.05.25. 01:45 | 0 |
| 2022.05.25. 02:00 | 0 |
| 2022.05.25. 02:15 | 0 |
| 2022.05.25. 02:30 | 0 |
| 2022.05.25. 02:45 | 0 |
| 2022.05.25. 03:00 | 0 |
| 2022.05.25. 03:15 | 0 |
| 2022.05.25. 03:30 | 0 |
| 2022.05.25. 03:45 | 0 |
| 2022.05.25. 04:00 | 0 |
| 2022.05.25. 04:15 | 0 |
| 2022.05.25. 04:30 | 0 |
| 2022.05.25. 04:45 | 0 |
| 2022.05.25. 05:00 | 0 |
| 2022.05.25. 05:15 | 0 |
| 2022.05.25. 05:30 | 0 |
| 2022.05.25. 05:45 | 0 |
| 2022.05.25. 06:00 | 0 |
| 2022.05.25. 06:15 | 0 |
| 2022.05.25. 06:30 | 0 |
| 2022.05.25. 06:45 | 0 |
| 2022.05.25. 07:00 | 0 |
| 2022.05.25. 07:15 | 0 |
| 2022.05.25. 07:30 | 0 |
| 2022.05.25. 07:45 | 0 |
| 2022.05.25. 08:00 | 0 |
| 2022.05.25. 08:15 | 0 |
| 2022.05.25. 08:30 | 0 |
| 2022.05.25. 08:45 | 0 |
| 2022.05.25. 09:00 | 0 |
| 2022.05.25. 09:15 | 0 |
| 2022.05.25. 09:30 | 0 |
| 2022.05.25. 09:45 | 0 |
| 2022.05.25. 10:00 | 0 |
| 2022.05.25. 10:15 | 0 |
| 2022.05.25. 10:30 | 0 |
| 2022.05.25. 10:45 | 0 |
| 2022.05.25. 11:00 | 0 |
| 2022.05.25. 11:15 | 0 |
| 2022.05.25. 11:30 | 0 |
| 2022.05.25. 11:45 | 0 |
| 2022.05.25. 12:00 | 0 |
| 2022.05.25. 12:15 | 0 |
| 2022.05.25. 12:30 | 0 |
| 2022.05.25. 12:45 | 0 |
| 2022.05.25. 13:00 | 0 |
| 2022.05.25. 13:15 | 0 |
| 2022.05.25. 13:30 | 0 |
| 2022.05.25. 13:45 | 0 |
| 2022.05.25. 14:00 | 0 |
| 2022.05.25. 14:15 | 0 |
| 2022.05.25. 14:30 | 0 |
| 2022.05.25. 14:45 | 0 |
| 2022.05.25. 15:00 | 0 |
| 2022.05.25. 15:15 | 0 |
| 2022.05.25. 15:30 | 0 |
| 2022.05.25. 15:45 | 0 |
| 2022.05.25. 16:00 | 0 |
| 2022.05.25. 16:15 | 0 |
| 2022.05.25. 16:30 | 0 |
| 2022.05.25. 16:45 | 0 |
| 2022.05.25. 17:00 | 0 |
| 2022.05.25. 17:15 | 0 |
| 2022.05.25. 17:30 | 0 |
| 2022.05.25. 17:45 | 0 |
| 2022.05.25. 18:00 | 0 |
| 2022.05.25. 18:15 | 0 |
| 2022.05.25. 18:30 | 0 |
| 2022.05.25. 18:45 | 0 |
| 2022.05.25. 19:00 | 0 |
| 2022.05.25. 19:15 | 0 |
| 2022.05.25. 19:30 | 0 |
| 2022.05.25. 19:45 | 0 |
| 2022.05.25. 20:00 | 0 |
| 2022.05.25. 20:15 | 0 |
| 2022.05.25. 20:30 | 0 |
| 2022.05.25. 20:45 | 0 |
| 2022.05.25. 21:00 | 0 |
| 2022.05.25. 21:15 | 0 |
| 2022.05.25. 21:30 | 0 |
| 2022.05.25. 21:45 | 0 |
| 2022.05.25. 22:00 | 0 |
| 2022.05.25. 22:15 | 0 |
| 2022.05.25. 22:30 | 0 |
| 2022.05.25. 22:45 | 0 |
| 2022.05.25. 23:00 | 0 |
| 2022.05.25. 23:15 | 0 |
| 2022.05.25. 23:30 | 0 |
| 2022.05.25. 23:45 | 0 |
| 2022.05.26. 00:00 | 0 |
| 2022.05.26. 00:15 | 0 |
| 2022.05.26. 00:30 | 0 |
| 2022.05.26. 00:45 | 0 |
| 2022.05.26. 01:00 | 0 |
| 2022.05.26. 01:15 | 0 |
| 2022.05.26. 01:30 | 0 |
| 2022.05.26. 01:45 | 0 |
| 2022.05.26. 02:00 | 0 |
| 2022.05.26. 02:15 | 0 |
| 2022.05.26. 02:30 | 0 |
| 2022.05.26. 02:45 | 0 |
| 2022.05.26. 03:00 | 0 |
| 2022.05.26. 03:15 | 0 |
| 2022.05.26. 03:30 | 0 |
| 2022.05.26. 03:45 | 0 |
| 2022.05.26. 04:00 | 0 |
| 2022.05.26. 04:15 | 0 |
| 2022.05.26. 04:30 | 0 |
| 2022.05.26. 04:45 | 0 |
| 2022.05.26. 05:00 | 0 |
| 2022.05.26. 05:15 | 0 |
| 2022.05.26. 05:30 | 0 |
| 2022.05.26. 05:45 | 0 |
| 2022.05.26. 06:00 | 0 |
| 2022.05.26. 06:15 | 0 |
| 2022.05.26. 06:30 | 0 |
| 2022.05.26. 06:45 | 0 |
| 2022.05.26. 07:00 | 0 |
| 2022.05.26. 07:15 | 0 |
| 2022.05.26. 07:30 | 0 |
| 2022.05.26. 07:45 | 0 |
| 2022.05.26. 08:00 | 0 |
| 2022.05.26. 08:15 | 0 |
| 2022.05.26. 08:30 | 0 |
| 2022.05.26. 08:45 | 0 |
| 2022.05.26. 09:00 | 0 |
| 2022.05.26. 09:15 | 0 |
| 2022.05.26. 09:30 | 0 |
| 2022.05.26. 09:45 | 0 |
| 2022.05.26. 10:00 | 0 |
| 2022.05.26. 10:15 | 0 |
| 2022.05.26. 10:30 | 0 |
| 2022.05.26. 10:45 | 0 |
| 2022.05.26. 11:00 | 0 |
| 2022.05.26. 11:15 | 0 |
| 2022.05.26. 11:30 | 0 |
| 2022.05.26. 11:45 | 0 |
| 2022.05.26. 12:00 | 0 |
| 2022.05.26. 12:15 | 0 |
| 2022.05.26. 12:30 | 0 |
| 2022.05.26. 12:45 | 0 |
| 2022.05.26. 13:00 | 0 |
| 2022.05.26. 13:15 | 0 |
| 2022.05.26. 13:30 | 0 |
| 2022.05.26. 13:45 | 0 |
| 2022.05.26. 14:00 | 0 |
| 2022.05.26. 14:15 | 0 |
| 2022.05.26. 14:30 | 0 |
| 2022.05.26. 14:45 | 0 |
| 2022.05.26. 15:00 | 0 |
| 2022.05.26. 15:15 | 0 |
| 2022.05.26. 15:30 | 0 |
| 2022.05.26. 15:45 | 0 |
| 2022.05.26. 16:00 | 0 |
| 2022.05.26. 16:15 | 0 |
| 2022.05.26. 16:30 | 0 |
| 2022.05.26. 16:45 | 0 |
| 2022.05.26. 17:00 | 0 |
| 2022.05.26. 17:15 | 0 |
| 2022.05.26. 17:30 | 0 |
| 2022.05.26. 17:45 | 0 |
| 2022.05.26. 18:00 | 0 |
| 2022.05.26. 18:15 | 0 |
| 2022.05.26. 18:30 | 0 |
| 2022.05.26. 18:45 | 0 |
| 2022.05.26. 19:00 | 0 |
| 2022.05.26. 19:15 | 0 |
| 2022.05.26. 19:30 | 0 |
| 2022.05.26. 19:45 | 0 |
| 2022.05.26. 20:00 | 0 |
| 2022.05.26. 20:15 | 0 |
| 2022.05.26. 20:30 | 0 |
| 2022.05.26. 20:45 | 0 |
| 2022.05.26. 21:00 | 0 |
| 2022.05.26. 21:15 | 0 |
| 2022.05.26. 21:30 | 0 |
| 2022.05.26. 21:45 | 0 |
| 2022.05.26. 22:00 | 0 |
| 2022.05.26. 22:15 | 0 |
| 2022.05.26. 22:30 | 0 |
| 2022.05.26. 22:45 | 0 |
| 2022.05.26. 23:00 | 0 |
| 2022.05.26. 23:15 | 0 |
| 2022.05.26. 23:30 | 0 |
| 2022.05.26. 23:45 | 0 |
| 2022.05.27. 00:00 | 0 |
| 2022.05.27. 00:15 | 0 |
| 2022.05.27. 00:30 | 0 |
| 2022.05.27. 00:45 | 0 |
| 2022.05.27. 01:00 | 0 |
| 2022.05.27. 01:15 | 0 |
| 2022.05.27. 01:30 | 0 |
| 2022.05.27. 01:45 | 0 |
| 2022.05.27. 02:00 | 0 |
| 2022.05.27. 02:15 | 0 |
| 2022.05.27. 02:30 | 0 |
| 2022.05.27. 02:45 | 0 |
| 2022.05.27. 03:00 | 0 |
| 2022.05.27. 03:15 | 0 |
| 2022.05.27. 03:30 | 0 |
| 2022.05.27. 03:45 | 0 |
| 2022.05.27. 04:00 | 0 |
| 2022.05.27. 04:15 | 0 |
| 2022.05.27. 04:30 | 0 |
| 2022.05.27. 04:45 | 0 |
| 2022.05.27. 05:00 | 0 |
| 2022.05.27. 05:15 | 0 |
| 2022.05.27. 05:30 | 0 |
| 2022.05.27. 05:45 | 0 |
| 2022.05.27. 06:00 | 0 |
| 2022.05.27. 06:15 | 0 |
| 2022.05.27. 06:30 | 0 |
| 2022.05.27. 06:45 | 0 |
| 2022.05.27. 07:00 | 0 |
| 2022.05.27. 07:15 | 0 |
| 2022.05.27. 07:30 | 0 |
| 2022.05.27. 07:45 | 0 |
| 2022.05.27. 08:00 | 0 |
| 2022.05.27. 08:15 | 0 |
| 2022.05.27. 08:30 | 0 |
| 2022.05.27. 08:45 | 0 |
| 2022.05.27. 09:00 | 0 |
| 2022.05.27. 09:15 | 0 |
| 2022.05.27. 09:30 | 0 |
| 2022.05.27. 09:45 | 0 |
| 2022.05.27. 10:00 | 0 |
| 2022.05.27. 10:15 | 0 |
| 2022.05.27. 10:30 | 0 |
| 2022.05.27. 10:45 | 0 |
| 2022.05.27. 11:00 | 0 |
| 2022.05.27. 11:15 | 0 |
| 2022.05.27. 11:30 | 0 |
| 2022.05.27. 11:45 | 0 |
| 2022.05.27. 12:00 | 0 |
| 2022.05.27. 12:15 | 0 |
| 2022.05.27. 12:30 | 0 |
| 2022.05.27. 12:45 | 0 |
| 2022.05.27. 13:00 | 0 |
| 2022.05.27. 13:15 | 0 |
| 2022.05.27. 13:30 | 0 |
| 2022.05.27. 13:45 | 0 |
| 2022.05.27. 14:00 | 0 |
| 2022.05.27. 14:15 | 0 |
| 2022.05.27. 14:30 | 0 |
| 2022.05.27. 14:45 | 0 |
| 2022.05.27. 15:00 | 0 |
| 2022.05.27. 15:15 | 0 |
| 2022.05.27. 15:30 | 0 |
| 2022.05.27. 15:45 | 0 |
| 2022.05.27. 16:00 | 0 |
| 2022.05.27. 16:15 | 0 |
| 2022.05.27. 16:30 | 0 |
| 2022.05.27. 16:45 | 0 |
| 2022.05.27. 17:00 | 0 |
| 2022.05.27. 17:15 | 0 |
| 2022.05.27. 17:30 | 0 |
| 2022.05.27. 17:45 | 0 |
| 2022.05.27. 18:00 | 0 |
| 2022.05.27. 18:15 | 0 |
| 2022.05.27. 18:30 | 0 |
| 2022.05.27. 18:45 | 0 |
| 2022.05.27. 19:00 | 0 |
| 2022.05.27. 19:15 | 0 |
| 2022.05.27. 19:30 | 0 |
| 2022.05.27. 19:45 | 0 |
| 2022.05.27. 20:00 | 0 |
| 2022.05.27. 20:15 | 0 |
| 2022.05.27. 20:30 | 0 |
| 2022.05.27. 20:45 | 0 |
| 2022.05.27. 21:00 | 0 |
| 2022.05.27. 21:15 | 0 |
| 2022.05.27. 21:30 | 0 |
| 2022.05.27. 21:45 | 0 |
| 2022.05.27. 22:00 | 0 |
| 2022.05.27. 22:15 | 0 |
| 2022.05.27. 22:30 | 0 |
| 2022.05.27. 22:45 | 0 |
| 2022.05.27. 23:00 | 0 |
| 2022.05.27. 23:15 | 0 |
| 2022.05.27. 23:30 | 0 |
| 2022.05.27. 23:45 | 0 |
| 2022.05.28. 00:00 | 0 |
| 2022.05.28. 00:15 | 0 |
| 2022.05.28. 00:30 | 0 |
| 2022.05.28. 00:45 | 0 |
| 2022.05.28. 01:00 | 0 |
| 2022.05.28. 01:15 | 0 |
| 2022.05.28. 01:30 | 0 |
| 2022.05.28. 01:45 | 0 |
| 2022.05.28. 02:00 | 0 |
| 2022.05.28. 02:15 | 0 |
| 2022.05.28. 02:30 | 0 |
| 2022.05.28. 02:45 | 0 |
| 2022.05.28. 03:00 | 0 |
| 2022.05.28. 03:15 | 0 |
| 2022.05.28. 03:30 | 0 |
| 2022.05.28. 03:45 | 0 |
| 2022.05.28. 04:00 | 0 |
| 2022.05.28. 04:15 | 0 |
| 2022.05.28. 04:30 | 0 |
| 2022.05.28. 04:45 | 0 |
| 2022.05.28. 05:00 | 0 |
| 2022.05.28. 05:15 | 0 |
| 2022.05.28. 05:30 | 0 |
| 2022.05.28. 05:45 | 0 |
| 2022.05.28. 06:00 | 0 |
| 2022.05.28. 06:15 | 0 |
| 2022.05.28. 06:30 | 0 |
| 2022.05.28. 06:45 | 0 |
| 2022.05.28. 07:00 | 0 |
| 2022.05.28. 07:15 | 0 |
| 2022.05.28. 07:30 | 0 |
| 2022.05.28. 07:45 | 0 |
| 2022.05.28. 08:00 | 0 |
| 2022.05.28. 08:15 | 0 |
| 2022.05.28. 08:30 | 0 |
| 2022.05.28. 08:45 | 0 |
| 2022.05.28. 09:00 | 0 |
| 2022.05.28. 09:15 | 0 |
| 2022.05.28. 09:30 | 0 |
| 2022.05.28. 09:45 | 0 |
| 2022.05.28. 10:00 | 0 |
| 2022.05.28. 10:15 | 0 |
| 2022.05.28. 10:30 | 0 |
| 2022.05.28. 10:45 | 0 |
| 2022.05.28. 11:00 | 0 |
| 2022.05.28. 11:15 | 0 |
| 2022.05.28. 11:30 | 0 |
| 2022.05.28. 11:45 | 0 |
| 2022.05.28. 12:00 | 0 |
| 2022.05.28. 12:15 | 0 |
| 2022.05.28. 12:30 | 0 |
| 2022.05.28. 12:45 | 0 |
| 2022.05.28. 13:00 | 0 |
| 2022.05.28. 13:15 | 0 |
| 2022.05.28. 13:30 | 0 |
| 2022.05.28. 13:45 | 0 |
| 2022.05.28. 14:00 | 0 |
| 2022.05.28. 14:15 | 0 |
| 2022.05.28. 14:30 | 0 |
| 2022.05.28. 14:45 | 0 |
| 2022.05.28. 15:00 | 0 |
| 2022.05.28. 15:15 | 0 |
| 2022.05.28. 15:30 | 0 |
| 2022.05.28. 15:45 | 0 |
| 2022.05.28. 16:00 | 0 |
| 2022.05.28. 16:15 | 0 |
| 2022.05.28. 16:30 | 0 |
| 2022.05.28. 16:45 | 0 |
| 2022.05.28. 17:00 | 0 |
| 2022.05.28. 17:15 | 0 |
| 2022.05.28. 17:30 | 0 |
| 2022.05.28. 17:45 | 0 |
| 2022.05.28. 18:00 | 0 |
| 2022.05.28. 18:15 | 0 |
| 2022.05.28. 18:30 | 0 |
| 2022.05.28. 18:45 | 0 |
| 2022.05.28. 19:00 | 0 |
| 2022.05.28. 19:15 | 0 |
| 2022.05.28. 19:30 | 0 |
| 2022.05.28. 19:45 | 0 |
| 2022.05.28. 20:00 | 0 |
| 2022.05.28. 20:15 | 0 |
| 2022.05.28. 20:30 | 0 |
| 2022.05.28. 20:45 | 0 |
| 2022.05.28. 21:00 | 0 |
| 2022.05.28. 21:15 | 0 |
| 2022.05.28. 21:30 | 0 |
| 2022.05.28. 21:45 | 0 |
| 2022.05.28. 22:00 | 0 |
| 2022.05.28. 22:15 | 0 |
| 2022.05.28. 22:30 | 0 |
| 2022.05.28. 22:45 | 0 |
| 2022.05.28. 23:00 | 0 |
| 2022.05.28. 23:15 | 0 |
| 2022.05.28. 23:30 | 0 |
| 2022.05.28. 23:45 | 0 |
| 2022.05.29. 00:00 | 0 |
| 2022.05.29. 00:15 | 0 |
| 2022.05.29. 00:30 | 0 |
| 2022.05.29. 00:45 | 0 |
| 2022.05.29. 01:00 | 0 |
| 2022.05.29. 01:15 | 0 |
| 2022.05.29. 01:30 | 0 |
| 2022.05.29. 01:45 | 0 |
| 2022.05.29. 02:00 | 0 |
| 2022.05.29. 02:15 | 0 |
| 2022.05.29. 02:30 | 0 |
| 2022.05.29. 02:45 | 0 |
| 2022.05.29. 03:00 | 0 |
| 2022.05.29. 03:15 | 0 |
| 2022.05.29. 03:30 | 0 |
| 2022.05.29. 03:45 | 0 |
| 2022.05.29. 04:00 | 0 |
| 2022.05.29. 04:15 | 0 |
| 2022.05.29. 04:30 | 0 |
| 2022.05.29. 04:45 | 0 |
| 2022.05.29. 05:00 | 0 |
| 2022.05.29. 05:15 | 0 |
| 2022.05.29. 05:30 | 0 |
| 2022.05.29. 05:45 | 0 |
| 2022.05.29. 06:00 | 0 |
| 2022.05.29. 06:15 | 0 |
| 2022.05.29. 06:30 | 0 |
| 2022.05.29. 06:45 | 0 |
| 2022.05.29. 07:00 | 0 |
| 2022.05.29. 07:15 | 0 |
| 2022.05.29. 07:30 | 0 |
| 2022.05.29. 07:45 | 0 |
| 2022.05.29. 08:00 | 0 |
| 2022.05.29. 08:15 | 0 |
| 2022.05.29. 08:30 | 0 |
| 2022.05.29. 08:45 | 0 |
| 2022.05.29. 09:00 | 0 |
| 2022.05.29. 09:15 | 0 |
| 2022.05.29. 09:30 | 0 |
| 2022.05.29. 09:45 | 0 |
| 2022.05.29. 10:00 | 0 |
| 2022.05.29. 10:15 | 0 |
| 2022.05.29. 10:30 | 0 |
| 2022.05.29. 10:45 | 0 |
| 2022.05.29. 11:00 | 0 |
| 2022.05.29. 11:15 | 0 |
| 2022.05.29. 11:30 | 0 |
| 2022.05.29. 11:45 | 0 |
| 2022.05.29. 12:00 | 0 |
| 2022.05.29. 12:15 | 0 |
| 2022.05.29. 12:30 | 0 |
| 2022.05.29. 12:45 | 0 |
| 2022.05.29. 13:00 | 0 |
| 2022.05.29. 13:15 | 0 |
| 2022.05.29. 13:30 | 0 |
| 2022.05.29. 13:45 | 0 |
| 2022.05.29. 14:00 | 0 |
| 2022.05.29. 14:15 | 0 |
| 2022.05.29. 14:30 | 0 |
| 2022.05.29. 14:45 | 0 |
| 2022.05.29. 15:00 | 0 |
| 2022.05.29. 15:15 | 0 |
| 2022.05.29. 15:30 | 0 |
| 2022.05.29. 15:45 | 0 |
| 2022.05.29. 16:00 | 0 |
| 2022.05.29. 16:15 | 0 |
| 2022.05.29. 16:30 | 0 |
| 2022.05.29. 16:45 | 0 |
| 2022.05.29. 17:00 | 0 |
| 2022.05.29. 17:15 | 0 |
| 2022.05.29. 17:30 | 0 |
| 2022.05.29. 17:45 | 0 |
| 2022.05.29. 18:00 | 0 |
| 2022.05.29. 18:15 | 0 |
| 2022.05.29. 18:30 | 0 |
| 2022.05.29. 18:45 | 0 |
| 2022.05.29. 19:00 | 0 |
| 2022.05.29. 19:15 | 0 |
| 2022.05.29. 19:30 | 0 |
| 2022.05.29. 19:45 | 0 |
| 2022.05.29. 20:00 | 0 |
| 2022.05.29. 20:15 | 0 |
| 2022.05.29. 20:30 | 0 |
| 2022.05.29. 20:45 | 0 |
| 2022.05.29. 21:00 | 0 |
| 2022.05.29. 21:15 | 0 |
| 2022.05.29. 21:30 | 0 |
| 2022.05.29. 21:45 | 0 |
| 2022.05.29. 22:00 | 0 |
| 2022.05.29. 22:15 | 0 |
| 2022.05.29. 22:30 | 0 |
| 2022.05.29. 22:45 | 0 |
| 2022.05.29. 23:00 | 0 |
| 2022.05.29. 23:15 | 0 |
| 2022.05.29. 23:30 | 0 |
| 2022.05.29. 23:45 | 0 |
| 2022.05.30. 00:00 | 0 |
| 2022.05.30. 00:15 | 0 |
| 2022.05.30. 00:30 | 0 |
| 2022.05.30. 00:45 | 0 |
| 2022.05.30. 01:00 | 0 |
| 2022.05.30. 01:15 | 0 |
| 2022.05.30. 01:30 | 0 |
| 2022.05.30. 01:45 | 0 |
| 2022.05.30. 02:00 | 0 |
| 2022.05.30. 02:15 | 0 |
| 2022.05.30. 02:30 | 0 |
| 2022.05.30. 02:45 | 0 |
| 2022.05.30. 03:00 | 0 |
| 2022.05.30. 03:15 | 0 |
| 2022.05.30. 03:30 | 0 |
| 2022.05.30. 03:45 | 0 |
| 2022.05.30. 04:00 | 0 |
| 2022.05.30. 04:15 | 0 |
| 2022.05.30. 04:30 | 0 |
| 2022.05.30. 04:45 | 0 |
| 2022.05.30. 05:00 | 0 |
| 2022.05.30. 05:15 | 0 |
| 2022.05.30. 05:30 | 0 |
| 2022.05.30. 05:45 | 0 |
| 2022.05.30. 06:00 | 0 |
| 2022.05.30. 06:15 | 0 |
| 2022.05.30. 06:30 | 0 |
| 2022.05.30. 06:45 | 0 |
| 2022.05.30. 07:00 | 0 |
| 2022.05.30. 07:15 | 0 |
| 2022.05.30. 07:30 | 0 |
| 2022.05.30. 07:45 | 0 |
| 2022.05.30. 08:00 | 0 |
| 2022.05.30. 08:15 | 0 |
| 2022.05.30. 08:30 | 0 |
| 2022.05.30. 08:45 | 0 |
| 2022.05.30. 09:00 | 0 |
| 2022.05.30. 09:15 | 0 |
| 2022.05.30. 09:30 | 0 |
| 2022.05.30. 09:45 | 0 |
| 2022.05.30. 10:00 | 0 |
| 2022.05.30. 10:15 | 0 |
| 2022.05.30. 10:30 | 0 |
| 2022.05.30. 10:45 | 0 |
| 2022.05.30. 11:00 | 0 |
| 2022.05.30. 11:15 | 0 |
| 2022.05.30. 11:30 | 0 |
| 2022.05.30. 11:45 | 0 |
| 2022.05.30. 12:00 | 0 |
| 2022.05.30. 12:15 | 0 |
| 2022.05.30. 12:30 | 0 |
| 2022.05.30. 12:45 | 0 |
| 2022.05.30. 13:00 | 0 |
| 2022.05.30. 13:15 | 0 |
| 2022.05.30. 13:30 | 0 |
| 2022.05.30. 13:45 | 0 |
| 2022.05.30. 14:00 | 0 |
| 2022.05.30. 14:15 | 0 |
| 2022.05.30. 14:30 | 0 |
| 2022.05.30. 14:45 | 0 |
| 2022.05.30. 15:00 | 0 |
| 2022.05.30. 15:15 | 0 |
| 2022.05.30. 15:30 | 0 |
| 2022.05.30. 15:45 | 0 |
| 2022.05.30. 16:00 | 0 |
| 2022.05.30. 16:15 | 0 |
| 2022.05.30. 16:30 | 0 |
| 2022.05.30. 16:45 | 0 |
| 2022.05.30. 17:00 | 0 |
| 2022.05.30. 17:15 | 0 |
| 2022.05.30. 17:30 | 0 |
| 2022.05.30. 17:45 | 0 |
| 2022.05.30. 18:00 | 0 |
| 2022.05.30. 18:15 | 0 |
| 2022.05.30. 18:30 | 0 |
| 2022.05.30. 18:45 | 0 |
| 2022.05.30. 19:00 | 0 |
| 2022.05.30. 19:15 | 0 |
| 2022.05.30. 19:30 | 0 |
| 2022.05.30. 19:45 | 0 |
| 2022.05.30. 20:00 | 0 |
| 2022.05.30. 20:15 | 0 |
| 2022.05.30. 20:30 | 0 |
| 2022.05.30. 20:45 | 0 |
| 2022.05.30. 21:00 | 0 |
| 2022.05.30. 21:15 | 0 |
| 2022.05.30. 21:30 | 0 |
| 2022.05.30. 21:45 | 0 |
| 2022.05.30. 22:00 | 0 |
| 2022.05.30. 22:15 | 0 |
| 2022.05.30. 22:30 | 0 |
| 2022.05.30. 22:45 | 0 |
| 2022.05.30. 23:00 | 0 |
| 2022.05.30. 23:15 | 0 |
| 2022.05.30. 23:30 | 0 |
| 2022.05.30. 23:45 | 0 |
| 2022.05.31. 00:00 | 0 |
| 2022.05.31. 00:15 | 0 |
| 2022.05.31. 00:30 | 0 |
| 2022.05.31. 00:45 | 0 |
| 2022.05.31. 01:00 | 0 |
| 2022.05.31. 01:15 | 0 |
| 2022.05.31. 01:30 | 0 |
| 2022.05.31. 01:45 | 0 |
| 2022.05.31. 02:00 | 0 |
| 2022.05.31. 02:15 | 0 |
| 2022.05.31. 02:30 | 0 |
| 2022.05.31. 02:45 | 0 |
| 2022.05.31. 03:00 | 0 |
| 2022.05.31. 03:15 | 0 |
| 2022.05.31. 03:30 | 0 |
| 2022.05.31. 03:45 | 0 |
| 2022.05.31. 04:00 | 0 |
| 2022.05.31. 04:15 | 0 |
| 2022.05.31. 04:30 | 0 |
| 2022.05.31. 04:45 | 0 |
| 2022.05.31. 05:00 | 0 |
| 2022.05.31. 05:15 | 0 |
| 2022.05.31. 05:30 | 0 |
| 2022.05.31. 05:45 | 0 |
| 2022.05.31. 06:00 | 0 |
| 2022.05.31. 06:15 | 0 |
| 2022.05.31. 06:30 | 0 |
| 2022.05.31. 06:45 | 0 |
| 2022.05.31. 07:00 | 0 |
| 2022.05.31. 07:15 | 0 |
| 2022.05.31. 07:30 | 0 |
| 2022.05.31. 07:45 | 0 |
| 2022.05.31. 08:00 | 0 |
| 2022.05.31. 08:15 | 0 |
| 2022.05.31. 08:30 | 0 |
| 2022.05.31. 08:45 | 0 |
| 2022.05.31. 09:00 | 0 |
| 2022.05.31. 09:15 | 0 |
| 2022.05.31. 09:30 | 0 |
| 2022.05.31. 09:45 | 0 |
| 2022.05.31. 10:00 | 0 |
| 2022.05.31. 10:15 | 0 |
| 2022.05.31. 10:30 | 0 |
| 2022.05.31. 10:45 | 0 |
| 2022.05.31. 11:00 | 0 |
| 2022.05.31. 11:15 | 0 |
| 2022.05.31. 11:30 | 0 |
| 2022.05.31. 11:45 | 0 |
| 2022.05.31. 12:00 | 0 |
| 2022.05.31. 12:15 | 0 |
| 2022.05.31. 12:30 | 0 |
| 2022.05.31. 12:45 | 0 |
| 2022.05.31. 13:00 | 0 |
| 2022.05.31. 13:15 | 0 |
| 2022.05.31. 13:30 | 0 |
| 2022.05.31. 13:45 | 0 |
| 2022.05.31. 14:00 | 0 |
| 2022.05.31. 14:15 | 0 |
| 2022.05.31. 14:30 | 0 |
| 2022.05.31. 14:45 | 0 |
| 2022.05.31. 15:00 | 0 |
| 2022.05.31. 15:15 | 0 |
| 2022.05.31. 15:30 | 0 |
| 2022.05.31. 15:45 | 0 |
| 2022.05.31. 16:00 | 0 |
| 2022.05.31. 16:15 | 0 |
| 2022.05.31. 16:30 | 0 |
| 2022.05.31. 16:45 | 0 |
| 2022.05.31. 17:00 | 0 |
| 2022.05.31. 17:15 | 0 |
| 2022.05.31. 17:30 | 0 |
| 2022.05.31. 17:45 | 0 |
| 2022.05.31. 18:00 | 0 |
| 2022.05.31. 18:15 | 0 |
| 2022.05.31. 18:30 | 0 |
| 2022.05.31. 18:45 | 0 |
| 2022.05.31. 19:00 | 0 |
| 2022.05.31. 19:15 | 0 |
| 2022.05.31. 19:30 | 0 |
| 2022.05.31. 19:45 | 0 |
| 2022.05.31. 20:00 | 0 |
| 2022.05.31. 20:15 | 0 |
| 2022.05.31. 20:30 | 0 |
| 2022.05.31. 20:45 | 0 |
| 2022.05.31. 21:00 | 0 |
| 2022.05.31. 21:15 | 0 |
| 2022.05.31. 21:30 | 0 |
| 2022.05.31. 21:45 | 0 |
| 2022.05.31. 22:00 | 0 |
| 2022.05.31. 22:15 | 0 |
| 2022.05.31. 22:30 | 0 |
| 2022.05.31. 22:45 | 0 |
| 2022.05.31. 23:00 | 0 |
| 2022.05.31. 23:15 | 0 |
| 2022.05.31. 23:30 | 0 |
| 2022.05.31. 23:45 | 0 |
| 2022.06.01. 00:00 | 0 |
| 2022.06.01. 00:15 | 0 |
| 2022.06.01. 00:30 | 0 |
| 2022.06.01. 00:45 | 0 |
| 2022.06.01. 01:00 | 0 |
| 2022.06.01. 01:15 | 0 |
| 2022.06.01. 01:30 | 0 |
| 2022.06.01. 01:45 | 0 |
| 2022.06.01. 02:00 | 0 |
| 2022.06.01. 02:15 | 0 |
| 2022.06.01. 02:30 | 0 |
| 2022.06.01. 02:45 | 0 |
| 2022.06.01. 03:00 | 0 |
| 2022.06.01. 03:15 | 0 |
| 2022.06.01. 03:30 | 0 |
| 2022.06.01. 03:45 | 0 |
| 2022.06.01. 04:00 | 0 |
| 2022.06.01. 04:15 | 0 |
| 2022.06.01. 04:30 | 0 |
| 2022.06.01. 04:45 | 0 |
| 2022.06.01. 05:00 | 0 |
| 2022.06.01. 05:15 | 0 |
| 2022.06.01. 05:30 | 0 |
| 2022.06.01. 05:45 | 0 |
| 2022.06.01. 06:00 | 0 |
| 2022.06.01. 06:15 | 0 |
| 2022.06.01. 06:30 | 0 |
| 2022.06.01. 06:45 | 0 |
| 2022.06.01. 07:00 | 0 |
| 2022.06.01. 07:15 | 0 |
| 2022.06.01. 07:30 | 0 |
| 2022.06.01. 07:45 | 0 |
| 2022.06.01. 08:00 | 0 |
| 2022.06.01. 08:15 | 0 |
| 2022.06.01. 08:30 | 0 |
| 2022.06.01. 08:45 | 0 |
| 2022.06.01. 09:00 | 0 |
| 2022.06.01. 09:15 | 0 |
| 2022.06.01. 09:30 | 0 |
| 2022.06.01. 09:45 | 0 |
| 2022.06.01. 10:00 | 0 |
| 2022.06.01. 10:15 | 0 |
| 2022.06.01. 10:30 | 0 |
| 2022.06.01. 10:45 | 0 |
| 2022.06.01. 11:00 | 0 |
| 2022.06.01. 11:15 | 0 |
| 2022.06.01. 11:30 | 0 |
| 2022.06.01. 11:45 | 0 |
| 2022.06.01. 12:00 | 0 |
| 2022.06.01. 12:15 | 0 |
| 2022.06.01. 12:30 | 0 |
| 2022.06.01. 12:45 | 0 |
| 2022.06.01. 13:00 | 0 |
| 2022.06.01. 13:15 | 0 |
| 2022.06.01. 13:30 | 0 |
| 2022.06.01. 13:45 | 0 |
| 2022.06.01. 14:00 | 0 |
| 2022.06.01. 14:15 | 0 |
| 2022.06.01. 14:30 | 0 |
| 2022.06.01. 14:45 | 0 |
| 2022.06.01. 15:00 | 0 |
| 2022.06.01. 15:15 | 0 |
| 2022.06.01. 15:30 | 0 |
| 2022.06.01. 15:45 | 0 |
| 2022.06.01. 16:00 | 0 |
| 2022.06.01. 16:15 | 0 |
| 2022.06.01. 16:30 | 0 |
| 2022.06.01. 16:45 | 0 |
| 2022.06.01. 17:00 | 0 |
| 2022.06.01. 17:15 | 0 |
| 2022.06.01. 17:30 | 0 |
| 2022.06.01. 17:45 | 0 |
| 2022.06.01. 18:00 | 0 |
| 2022.06.01. 18:15 | 0 |
| 2022.06.01. 18:30 | 0 |
| 2022.06.01. 18:45 | 0 |
| 2022.06.01. 19:00 | 0 |
| 2022.06.01. 19:15 | 0 |
| 2022.06.01. 19:30 | 0 |
| 2022.06.01. 19:45 | 0 |
| 2022.06.01. 20:00 | 0 |
| 2022.06.01. 20:15 | 0 |
| 2022.06.01. 20:30 | 0 |
| 2022.06.01. 20:45 | 0 |
| 2022.06.01. 21:00 | 0 |
| 2022.06.01. 21:15 | 0 |
| 2022.06.01. 21:30 | 0 |
| 2022.06.01. 21:45 | 0 |
| 2022.06.01. 22:00 | 0 |
| 2022.06.01. 22:15 | 0 |
| 2022.06.01. 22:30 | 0 |
| 2022.06.01. 22:45 | 0 |
| 2022.06.01. 23:00 | 0 |
| 2022.06.01. 23:15 | 0 |
| 2022.06.01. 23:30 | 0 |
| 2022.06.01. 23:45 | 0 |
| 2022.06.02. 00:00 | 0 |
| 2022.06.02. 00:15 | 0 |
| 2022.06.02. 00:30 | 0 |
| 2022.06.02. 00:45 | 0 |
| 2022.06.02. 01:00 | 0 |
| 2022.06.02. 01:15 | 0 |
| 2022.06.02. 01:30 | 0 |
| 2022.06.02. 01:45 | 0 |
| 2022.06.02. 02:00 | 0 |
| 2022.06.02. 02:15 | 0 |
| 2022.06.02. 02:30 | 0 |
| 2022.06.02. 02:45 | 0 |
| 2022.06.02. 03:00 | 0 |
| 2022.06.02. 03:15 | 0 |
| 2022.06.02. 03:30 | 0 |
| 2022.06.02. 03:45 | 0 |
| 2022.06.02. 04:00 | 0 |
| 2022.06.02. 04:15 | 0 |
| 2022.06.02. 04:30 | 0 |
| 2022.06.02. 04:45 | 0 |
| 2022.06.02. 05:00 | 0 |
| 2022.06.02. 05:15 | 0 |
| 2022.06.02. 05:30 | 0 |
| 2022.06.02. 05:45 | 0 |
| 2022.06.02. 06:00 | 0 |
| 2022.06.02. 06:15 | 0 |
| 2022.06.02. 06:30 | 0 |
| 2022.06.02. 06:45 | 0 |
| 2022.06.02. 07:00 | 0 |
| 2022.06.02. 07:15 | 0 |
| 2022.06.02. 07:30 | 0 |
| 2022.06.02. 07:45 | 0 |
| 2022.06.02. 08:00 | 0 |
| 2022.06.02. 08:15 | 0 |
| 2022.06.02. 08:30 | 0 |
| 2022.06.02. 08:45 | 0 |
| 2022.06.02. 09:00 | 0 |
| 2022.06.02. 09:15 | 0 |
| 2022.06.02. 09:30 | 0 |
| 2022.06.02. 09:45 | 0 |
| 2022.06.02. 10:00 | 0 |
| 2022.06.02. 10:15 | 0 |
| 2022.06.02. 10:30 | 0 |
| 2022.06.02. 10:45 | 0 |
| 2022.06.02. 11:00 | 0 |
| 2022.06.02. 11:15 | 0 |
| 2022.06.02. 11:30 | 0 |
| 2022.06.02. 11:45 | 0 |
| 2022.06.02. 12:00 | 0 |
| 2022.06.02. 12:15 | 0 |
| 2022.06.02. 12:30 | 0 |
| 2022.06.02. 12:45 | 0 |
| 2022.06.02. 13:00 | 0 |
| 2022.06.02. 13:15 | 0 |
| 2022.06.02. 13:30 | 0 |
| 2022.06.02. 13:45 | 0 |
| 2022.06.02. 14:00 | 0 |
| 2022.06.02. 14:15 | 0 |
| 2022.06.02. 14:30 | 0 |
| 2022.06.02. 14:45 | 0 |
| 2022.06.02. 15:00 | 0 |
| 2022.06.02. 15:15 | 0 |
| 2022.06.02. 15:30 | 0 |
| 2022.06.02. 15:45 | 0 |
| 2022.06.02. 16:00 | 0 |
| 2022.06.02. 16:15 | 0 |
| 2022.06.02. 16:30 | 0 |
| 2022.06.02. 16:45 | 0 |
| 2022.06.02. 17:00 | 0 |
| 2022.06.02. 17:15 | 0 |
| 2022.06.02. 17:30 | 0 |
| 2022.06.02. 17:45 | 0 |
| 2022.06.02. 18:00 | 0 |
| 2022.06.02. 18:15 | 0 |
| 2022.06.02. 18:30 | 0 |
| 2022.06.02. 18:45 | 0 |
| 2022.06.02. 19:00 | 0 |
| 2022.06.02. 19:15 | 0 |
| 2022.06.02. 19:30 | 0 |
| 2022.06.02. 19:45 | 0 |
| 2022.06.02. 20:00 | 0 |
| 2022.06.02. 20:15 | 0 |
| 2022.06.02. 20:30 | 0 |
| 2022.06.02. 20:45 | 0 |
| 2022.06.02. 21:00 | 0 |
| 2022.06.02. 21:15 | 0 |
| 2022.06.02. 21:30 | 0 |
| 2022.06.02. 21:45 | 0 |
| 2022.06.02. 22:00 | 0 |
| 2022.06.02. 22:15 | 0 |
| 2022.06.02. 22:30 | 0 |
| 2022.06.02. 22:45 | 0 |
| 2022.06.02. 23:00 | 0 |
| 2022.06.02. 23:15 | 0 |
| 2022.06.02. 23:30 | 0 |
| 2022.06.02. 23:45 | 0 |
| 2022.06.03. 00:00 | 0 |
| 2022.06.03. 00:15 | 0 |
| 2022.06.03. 00:30 | 0 |
| 2022.06.03. 00:45 | 0 |
| 2022.06.03. 01:00 | 0 |
| 2022.06.03. 01:15 | 0 |
| 2022.06.03. 01:30 | 0 |
| 2022.06.03. 01:45 | 0 |
| 2022.06.03. 02:00 | 0 |
| 2022.06.03. 02:15 | 0 |
| 2022.06.03. 02:30 | 0 |
| 2022.06.03. 02:45 | 0 |
| 2022.06.03. 03:00 | 0 |
| 2022.06.03. 03:15 | 0 |
| 2022.06.03. 03:30 | 0 |
| 2022.06.03. 03:45 | 0 |
| 2022.06.03. 04:00 | 0 |
| 2022.06.03. 04:15 | 0 |
| 2022.06.03. 04:30 | 0 |
| 2022.06.03. 04:45 | 0 |
| 2022.06.03. 05:00 | 0 |
| 2022.06.03. 05:15 | 0 |
| 2022.06.03. 05:30 | 0 |
| 2022.06.03. 05:45 | 0 |
| 2022.06.03. 06:00 | 0 |
| 2022.06.03. 06:15 | 0 |
| 2022.06.03. 06:30 | 0 |
| 2022.06.03. 06:45 | 0 |
| 2022.06.03. 07:00 | 0 |
| 2022.06.03. 07:15 | 0 |
| 2022.06.03. 07:30 | 0 |
| 2022.06.03. 07:45 | 0 |
| 2022.06.03. 08:00 | 0 |
| 2022.06.03. 08:15 | 0 |
| 2022.06.03. 08:30 | 0 |
| 2022.06.03. 08:45 | 0 |
| 2022.06.03. 09:00 | 0 |
| 2022.06.03. 09:15 | 0 |
| 2022.06.03. 09:30 | 0 |
| 2022.06.03. 09:45 | 0 |
| 2022.06.03. 10:00 | 0 |
| 2022.06.03. 10:15 | 0 |
| 2022.06.03. 10:30 | 0 |
| 2022.06.03. 10:45 | 0 |
| 2022.06.03. 11:00 | 0 |
| 2022.06.03. 11:15 | 0 |
| 2022.06.03. 11:30 | 0 |
| 2022.06.03. 11:45 | 0 |
| 2022.06.03. 12:00 | 0 |
| 2022.06.03. 12:15 | 0 |
| 2022.06.03. 12:30 | 0 |
| 2022.06.03. 12:45 | 0 |
| 2022.06.03. 13:00 | 0 |
| 2022.06.03. 13:15 | 0 |
| 2022.06.03. 13:30 | 0 |
| 2022.06.03. 13:45 | 0 |
| 2022.06.03. 14:00 | 0 |
| 2022.06.03. 14:15 | 0 |
| 2022.06.03. 14:30 | 0 |
| 2022.06.03. 14:45 | 0 |
| 2022.06.03. 15:00 | 0 |
| 2022.06.03. 15:15 | 0 |
| 2022.06.03. 15:30 | 0 |
| 2022.06.03. 15:45 | 0 |
| 2022.06.03. 16:00 | 0 |
| 2022.06.03. 16:15 | 0 |
| 2022.06.03. 16:30 | 0 |
| 2022.06.03. 16:45 | 0 |
| 2022.06.03. 17:00 | 0 |
| 2022.06.03. 17:15 | 0 |
| 2022.06.03. 17:30 | 0 |
| 2022.06.03. 17:45 | 0 |
| 2022.06.03. 18:00 | 0 |
| 2022.06.03. 18:15 | 0 |
| 2022.06.03. 18:30 | 0 |
| 2022.06.03. 18:45 | 0 |
| 2022.06.03. 19:00 | 0 |
| 2022.06.03. 19:15 | 0 |
| 2022.06.03. 19:30 | 0 |
| 2022.06.03. 19:45 | 0 |
| 2022.06.03. 20:00 | 0 |
| 2022.06.03. 20:15 | 0 |
| 2022.06.03. 20:30 | 0 |
| 2022.06.03. 20:45 | 0 |
| 2022.06.03. 21:00 | 0 |
| 2022.06.03. 21:15 | 0 |
| 2022.06.03. 21:30 | 0 |
| 2022.06.03. 21:45 | 0 |
| 2022.06.03. 22:00 | 0 |
| 2022.06.03. 22:15 | 0 |
| 2022.06.03. 22:30 | 0 |
| 2022.06.03. 22:45 | 0 |
| 2022.06.03. 23:00 | 0 |
| 2022.06.03. 23:15 | 0 |
| 2022.06.03. 23:30 | 0 |
| 2022.06.03. 23:45 | 0 |
| 2022.06.04. 00:00 | 0 |
| 2022.06.04. 00:15 | 0 |
| 2022.06.04. 00:30 | 0 |
| 2022.06.04. 00:45 | 0 |
| 2022.06.04. 01:00 | 0 |
| 2022.06.04. 01:15 | 0 |
| 2022.06.04. 01:30 | 0 |
| 2022.06.04. 01:45 | 0 |
| 2022.06.04. 02:00 | 0 |
| 2022.06.04. 02:15 | 0 |
| 2022.06.04. 02:30 | 0 |
| 2022.06.04. 02:45 | 0 |
| 2022.06.04. 03:00 | 0 |
| 2022.06.04. 03:15 | 0 |
| 2022.06.04. 03:30 | 0 |
| 2022.06.04. 03:45 | 0 |
| 2022.06.04. 04:00 | 0 |
| 2022.06.04. 04:15 | 0 |
| 2022.06.04. 04:30 | 0 |
| 2022.06.04. 04:45 | 0 |
| 2022.06.04. 05:00 | 0 |
| 2022.06.04. 05:15 | 0 |
| 2022.06.04. 05:30 | 0 |
| 2022.06.04. 05:45 | 0 |
| 2022.06.04. 06:00 | 0 |
| 2022.06.04. 06:15 | 0 |
| 2022.06.04. 06:30 | 0 |
| 2022.06.04. 06:45 | 0 |
| 2022.06.04. 07:00 | 0 |
| 2022.06.04. 07:15 | 0 |
| 2022.06.04. 07:30 | 0 |
| 2022.06.04. 07:45 | 0 |
| 2022.06.04. 08:00 | 0 |
| 2022.06.04. 08:15 | 0 |
| 2022.06.04. 08:30 | 0 |
| 2022.06.04. 08:45 | 0 |
| 2022.06.04. 09:00 | 0 |
| 2022.06.04. 09:15 | 0 |
| 2022.06.04. 09:30 | 0 |
| 2022.06.04. 09:45 | 0 |
| 2022.06.04. 10:00 | 0 |
| 2022.06.04. 10:15 | 0 |
| 2022.06.04. 10:30 | 0 |
| 2022.06.04. 10:45 | 0 |
| 2022.06.04. 11:00 | 0 |
| 2022.06.04. 11:15 | 0 |
| 2022.06.04. 11:30 | 0 |
| 2022.06.04. 11:45 | 0 |
| 2022.06.04. 12:00 | 0 |
| 2022.06.04. 12:15 | 0 |
| 2022.06.04. 12:30 | 0 |
| 2022.06.04. 12:45 | 0 |
| 2022.06.04. 13:00 | 0 |
| 2022.06.04. 13:15 | 0 |
| 2022.06.04. 13:30 | 0 |
| 2022.06.04. 13:45 | 0 |
| 2022.06.04. 14:00 | 0 |
| 2022.06.04. 14:15 | 0 |
| 2022.06.04. 14:30 | 0 |
| 2022.06.04. 14:45 | 0 |
| 2022.06.04. 15:00 | 0 |
| 2022.06.04. 15:15 | 0 |
| 2022.06.04. 15:30 | 0 |
| 2022.06.04. 15:45 | 0 |
| 2022.06.04. 16:00 | 0 |
| 2022.06.04. 16:15 | 0 |
| 2022.06.04. 16:30 | 0 |
| 2022.06.04. 16:45 | 0 |
| 2022.06.04. 17:00 | 0 |
| 2022.06.04. 17:15 | 0 |
| 2022.06.04. 17:30 | 0 |
| 2022.06.04. 17:45 | 0 |
| 2022.06.04. 18:00 | 0 |
| 2022.06.04. 18:15 | 0 |
| 2022.06.04. 18:30 | 0 |
| 2022.06.04. 18:45 | 0 |
| 2022.06.04. 19:00 | 0 |
| 2022.06.04. 19:15 | 0 |
| 2022.06.04. 19:30 | 0 |
| 2022.06.04. 19:45 | 0 |
| 2022.06.04. 20:00 | 0 |
| 2022.06.04. 20:15 | 0 |
| 2022.06.04. 20:30 | 0 |
| 2022.06.04. 20:45 | 0 |
| 2022.06.04. 21:00 | 0 |
| 2022.06.04. 21:15 | 0 |
| 2022.06.04. 21:30 | 0 |
| 2022.06.04. 21:45 | 0 |
| 2022.06.04. 22:00 | 0 |
| 2022.06.04. 22:15 | 0 |
| 2022.06.04. 22:30 | 0 |
| 2022.06.04. 22:45 | 0 |
| 2022.06.04. 23:00 | 0 |
| 2022.06.04. 23:15 | 0 |
| 2022.06.04. 23:30 | 0 |
| 2022.06.04. 23:45 | 0 |
| 2022.06.05. 00:00 | 0 |
| 2022.06.05. 00:15 | 0 |
| 2022.06.05. 00:30 | 0 |
| 2022.06.05. 00:45 | 0 |
| 2022.06.05. 01:00 | 0 |
| 2022.06.05. 01:15 | 0 |
| 2022.06.05. 01:30 | 0 |
| 2022.06.05. 01:45 | 0 |
| 2022.06.05. 02:00 | 0 |
| 2022.06.05. 02:15 | 0 |
| 2022.06.05. 02:30 | 0 |
| 2022.06.05. 02:45 | 0 |
| 2022.06.05. 03:00 | 0 |
| 2022.06.05. 03:15 | 0 |
| 2022.06.05. 03:30 | 0 |
| 2022.06.05. 03:45 | 0 |
| 2022.06.05. 04:00 | 0 |
| 2022.06.05. 04:15 | 0 |
| 2022.06.05. 04:30 | 0 |
| 2022.06.05. 04:45 | 0 |
| 2022.06.05. 05:00 | 0 |
| 2022.06.05. 05:15 | 0 |
| 2022.06.05. 05:30 | 0 |
| 2022.06.05. 05:45 | 0 |
| 2022.06.05. 06:00 | 0 |
| 2022.06.05. 06:15 | 0 |
| 2022.06.05. 06:30 | 0 |
| 2022.06.05. 06:45 | 0 |
| 2022.06.05. 07:00 | 0 |
| 2022.06.05. 07:15 | 0 |
| 2022.06.05. 07:30 | 0 |
| 2022.06.05. 07:45 | 0 |
| 2022.06.05. 08:00 | 0 |
| 2022.06.05. 08:15 | 0 |
| 2022.06.05. 08:30 | 0 |
| 2022.06.05. 08:45 | 0 |
| 2022.06.05. 09:00 | 0 |
| 2022.06.05. 09:15 | 0 |
| 2022.06.05. 09:30 | 0 |
| 2022.06.05. 09:45 | 0 |
| 2022.06.05. 10:00 | 0 |
| 2022.06.05. 10:15 | 0 |
| 2022.06.05. 10:30 | 0 |
| 2022.06.05. 10:45 | 0 |
| 2022.06.05. 11:00 | 0 |
| 2022.06.05. 11:15 | 0 |
| 2022.06.05. 11:30 | 0 |
| 2022.06.05. 11:45 | 0 |
| 2022.06.05. 12:00 | 0 |
| 2022.06.05. 12:15 | 0 |
| 2022.06.05. 12:30 | 0 |
| 2022.06.05. 12:45 | 0 |
| 2022.06.05. 13:00 | 0 |
| 2022.06.05. 13:15 | 0 |
| 2022.06.05. 13:30 | 0 |
| 2022.06.05. 13:45 | 0 |
| 2022.06.05. 14:00 | 0 |
| 2022.06.05. 14:15 | 0 |
| 2022.06.05. 14:30 | 0 |
| 2022.06.05. 14:45 | 0 |
| 2022.06.05. 15:00 | 0 |
| 2022.06.05. 15:15 | 0 |
| 2022.06.05. 15:30 | 0 |
| 2022.06.05. 15:45 | 0 |
| 2022.06.05. 16:00 | 0 |
| 2022.06.05. 16:15 | 0 |
| 2022.06.05. 16:30 | 0 |
| 2022.06.05. 16:45 | 0 |
| 2022.06.05. 17:00 | 0 |
| 2022.06.05. 17:15 | 0 |
| 2022.06.05. 17:30 | 0 |
| 2022.06.05. 17:45 | 0 |
| 2022.06.05. 18:00 | 0 |
| 2022.06.05. 18:15 | 0 |
| 2022.06.05. 18:30 | 0 |
| 2022.06.05. 18:45 | 0 |
| 2022.06.05. 19:00 | 0 |
| 2022.06.05. 19:15 | 0 |
| 2022.06.05. 19:30 | 0 |
| 2022.06.05. 19:45 | 0 |
| 2022.06.05. 20:00 | 0 |
| 2022.06.05. 20:15 | 0 |
| 2022.06.05. 20:30 | 0 |
| 2022.06.05. 20:45 | 0 |
| 2022.06.05. 21:00 | 0 |
| 2022.06.05. 21:15 | 0 |
| 2022.06.05. 21:30 | 0 |
| 2022.06.05. 21:45 | 0 |
| 2022.06.05. 22:00 | 0 |
| 2022.06.05. 22:15 | 0 |
| 2022.06.05. 22:30 | 0 |
| 2022.06.05. 22:45 | 0 |
| 2022.06.05. 23:00 | 0 |
| 2022.06.05. 23:15 | 0 |
| 2022.06.05. 23:30 | 0 |
| 2022.06.05. 23:45 | 0 |
| 2022.06.06. 00:00 | 0 |
| 2022.06.06. 00:15 | 0 |
| 2022.06.06. 00:30 | 0 |
| 2022.06.06. 00:45 | 0 |
| 2022.06.06. 01:00 | 0 |
| 2022.06.06. 01:15 | 0 |
| 2022.06.06. 01:30 | 0 |
| 2022.06.06. 01:45 | 0 |
| 2022.06.06. 02:00 | 0 |
| 2022.06.06. 02:15 | 0 |
| 2022.06.06. 02:30 | 0 |
| 2022.06.06. 02:45 | 0 |
| 2022.06.06. 03:00 | 0 |
| 2022.06.06. 03:15 | 0 |
| 2022.06.06. 03:30 | 0 |
| 2022.06.06. 03:45 | 0 |
| 2022.06.06. 04:00 | 0 |
| 2022.06.06. 04:15 | 0 |
| 2022.06.06. 04:30 | 0 |
| 2022.06.06. 04:45 | 0 |
| 2022.06.06. 05:00 | 0 |
| 2022.06.06. 05:15 | 0 |
| 2022.06.06. 05:30 | 0 |
| 2022.06.06. 05:45 | 0 |
| 2022.06.06. 06:00 | 0 |
| 2022.06.06. 06:15 | 0 |
| 2022.06.06. 06:30 | 0 |
| 2022.06.06. 06:45 | 0 |
| 2022.06.06. 07:00 | 0 |
| 2022.06.06. 07:15 | 0 |
| 2022.06.06. 07:30 | 0 |
| 2022.06.06. 07:45 | 0 |
| 2022.06.06. 08:00 | 0 |
| 2022.06.06. 08:15 | 0 |
| 2022.06.06. 08:30 | 0 |
| 2022.06.06. 08:45 | 0 |
| 2022.06.06. 09:00 | 0 |
| 2022.06.06. 09:15 | 0 |
| 2022.06.06. 09:30 | 0 |
| 2022.06.06. 09:45 | 0 |
| 2022.06.06. 10:00 | 0 |
| 2022.06.06. 10:15 | 0 |
| 2022.06.06. 10:30 | 0 |
| 2022.06.06. 10:45 | 0 |
| 2022.06.06. 11:00 | 0 |
| 2022.06.06. 11:15 | 0 |
| 2022.06.06. 11:30 | 0 |
| 2022.06.06. 11:45 | 0 |
| 2022.06.06. 12:00 | 0 |
| 2022.06.06. 12:15 | 0 |
| 2022.06.06. 12:30 | 0 |
| 2022.06.06. 12:45 | 0 |
| 2022.06.06. 13:00 | 0 |
| 2022.06.06. 13:15 | 0 |
| 2022.06.06. 13:30 | 0 |
| 2022.06.06. 13:45 | 0 |
| 2022.06.06. 14:00 | 0 |
| 2022.06.06. 14:15 | 0 |
| 2022.06.06. 14:30 | 0 |
| 2022.06.06. 14:45 | 0 |
| 2022.06.06. 15:00 | 0 |
| 2022.06.06. 15:15 | 0 |
| 2022.06.06. 15:30 | 0 |
| 2022.06.06. 15:45 | 0 |
| 2022.06.06. 16:00 | 0 |
| 2022.06.06. 16:15 | 0 |
| 2022.06.06. 16:30 | 0 |
| 2022.06.06. 16:45 | 0 |
| 2022.06.06. 17:00 | 0 |
| 2022.06.06. 17:15 | 0 |
| 2022.06.06. 17:30 | 0 |
| 2022.06.06. 17:45 | 0 |
| 2022.06.06. 18:00 | 0 |
| 2022.06.06. 18:15 | 0 |
| 2022.06.06. 18:30 | 0 |
| 2022.06.06. 18:45 | 0 |
| 2022.06.06. 19:00 | 0 |
| 2022.06.06. 19:15 | 0 |
| 2022.06.06. 19:30 | 0 |
| 2022.06.06. 19:45 | 0 |
| 2022.06.06. 20:00 | 0 |
| 2022.06.06. 20:15 | 0 |
| 2022.06.06. 20:30 | 0 |
| 2022.06.06. 20:45 | 0 |
| 2022.06.06. 21:00 | 0 |
| 2022.06.06. 21:15 | 0 |
| 2022.06.06. 21:30 | 0 |
| 2022.06.06. 21:45 | 0 |
| 2022.06.06. 22:00 | 0 |
| 2022.06.06. 22:15 | 0 |
| 2022.06.06. 22:30 | 0 |
| 2022.06.06. 22:45 | 0 |
| 2022.06.06. 23:00 | 0 |
| 2022.06.06. 23:15 | 0 |
| 2022.06.06. 23:30 | 0 |
| 2022.06.06. 23:45 | 0 |
| 2022.06.07. 00:00 | 0 |
| 2022.06.07. 00:15 | 0 |
| 2022.06.07. 00:30 | 0 |
| 2022.06.07. 00:45 | 0 |
| 2022.06.07. 01:00 | 0 |
| 2022.06.07. 01:15 | 0 |
| 2022.06.07. 01:30 | 0 |
| 2022.06.07. 01:45 | 0 |
| 2022.06.07. 02:00 | 0 |
| 2022.06.07. 02:15 | 0 |
| 2022.06.07. 02:30 | 0 |
| 2022.06.07. 02:45 | 0 |
| 2022.06.07. 03:00 | 0 |
| 2022.06.07. 03:15 | 0 |
| 2022.06.07. 03:30 | 0 |
| 2022.06.07. 03:45 | 0 |
| 2022.06.07. 04:00 | 0 |
| 2022.06.07. 04:15 | 0 |
| 2022.06.07. 04:30 | 0 |
| 2022.06.07. 04:45 | 0 |
| 2022.06.07. 05:00 | 0 |
| 2022.06.07. 05:15 | 0 |
| 2022.06.07. 05:30 | 0 |
| 2022.06.07. 05:45 | 0 |
| 2022.06.07. 06:00 | 0 |
| 2022.06.07. 06:15 | 0 |
| 2022.06.07. 06:30 | 0 |
| 2022.06.07. 06:45 | 0 |
| 2022.06.07. 07:00 | 0 |
| 2022.06.07. 07:15 | 0 |
| 2022.06.07. 07:30 | 0 |
| 2022.06.07. 07:45 | 0 |
| 2022.06.07. 08:00 | 0 |
| 2022.06.07. 08:15 | 0 |
| 2022.06.07. 08:30 | 0 |
| 2022.06.07. 08:45 | 0 |
| 2022.06.07. 09:00 | 0 |
| 2022.06.07. 09:15 | 0 |
| 2022.06.07. 09:30 | 0 |
| 2022.06.07. 09:45 | 0 |
| 2022.06.07. 10:00 | 0 |
| 2022.06.07. 10:15 | 0 |
| 2022.06.07. 10:30 | 0 |
| 2022.06.07. 10:45 | 0 |
| 2022.06.07. 11:00 | 0 |
| 2022.06.07. 11:15 | 0 |
| 2022.06.07. 11:30 | 0 |
| 2022.06.07. 11:45 | 0 |
| 2022.06.07. 12:00 | 0 |
| 2022.06.07. 12:15 | 0 |
| 2022.06.07. 12:30 | 0 |
| 2022.06.07. 12:45 | 0 |
| 2022.06.07. 13:00 | 0 |
| 2022.06.07. 13:15 | 0 |
| 2022.06.07. 13:30 | 0 |
| 2022.06.07. 13:45 | 0 |
| 2022.06.07. 14:00 | 0 |
| 2022.06.07. 14:15 | 0 |
| 2022.06.07. 14:30 | 0 |
| 2022.06.07. 14:45 | 0 |
| 2022.06.07. 15:00 | 0 |
| 2022.06.07. 15:15 | 0 |
| 2022.06.07. 15:30 | 0 |
| 2022.06.07. 15:45 | 0 |
| 2022.06.07. 16:00 | 0 |
| 2022.06.07. 16:15 | 0 |
| 2022.06.07. 16:30 | 0 |
| 2022.06.07. 16:45 | 0 |
| 2022.06.07. 17:00 | 0 |
| 2022.06.07. 17:15 | 0 |
| 2022.06.07. 17:30 | 0 |
| 2022.06.07. 17:45 | 0 |
| 2022.06.07. 18:00 | 0 |
| 2022.06.07. 18:15 | 0 |
| 2022.06.07. 18:30 | 0 |
| 2022.06.07. 18:45 | 0 |
| 2022.06.07. 19:00 | 0 |
| 2022.06.07. 19:15 | 0 |
| 2022.06.07. 19:30 | 0 |
| 2022.06.07. 19:45 | 0 |
| 2022.06.07. 20:00 | 0 |
| 2022.06.07. 20:15 | 0 |
| 2022.06.07. 20:30 | 0 |
| 2022.06.07. 20:45 | 0 |
| 2022.06.07. 21:00 | 0 |
| 2022.06.07. 21:15 | 0 |
| 2022.06.07. 21:30 | 0 |
| 2022.06.07. 21:45 | 0 |
| 2022.06.07. 22:00 | 0 |
| 2022.06.07. 22:15 | 0 |
| 2022.06.07. 22:30 | 0 |
| 2022.06.07. 22:45 | 0 |
| 2022.06.07. 23:00 | 0 |
| 2022.06.07. 23:15 | 0 |
| 2022.06.07. 23:30 | 0 |
| 2022.06.07. 23:45 | 0 |
| 2022.06.08. 00:00 | 0 |
| 2022.06.08. 00:15 | 0 |
| 2022.06.08. 00:30 | 0 |
| 2022.06.08. 00:45 | 0 |
| 2022.06.08. 01:00 | 0 |
| 2022.06.08. 01:15 | 0 |
| 2022.06.08. 01:30 | 0 |
| 2022.06.08. 01:45 | 0 |
| 2022.06.08. 02:00 | 0 |
| 2022.06.08. 02:15 | 0 |
| 2022.06.08. 02:30 | 0 |
| 2022.06.08. 02:45 | 0 |
| 2022.06.08. 03:00 | 0 |
| 2022.06.08. 03:15 | 0 |
| 2022.06.08. 03:30 | 0 |
| 2022.06.08. 03:45 | 0 |
| 2022.06.08. 04:00 | 0 |
| 2022.06.08. 04:15 | 0 |
| 2022.06.08. 04:30 | 0 |
| 2022.06.08. 04:45 | 0 |
| 2022.06.08. 05:00 | 0 |
| 2022.06.08. 05:15 | 0 |
| 2022.06.08. 05:30 | 0 |
| 2022.06.08. 05:45 | 0 |
| 2022.06.08. 06:00 | 0 |
| 2022.06.08. 06:15 | 0 |
| 2022.06.08. 06:30 | 0 |
| 2022.06.08. 06:45 | 0 |
| 2022.06.08. 07:00 | 0 |
| 2022.06.08. 07:15 | 0 |
| 2022.06.08. 07:30 | 0 |
| 2022.06.08. 07:45 | 0 |
| 2022.06.08. 08:00 | 0 |
| 2022.06.08. 08:15 | 0 |
| 2022.06.08. 08:30 | 0 |
| 2022.06.08. 08:45 | 0 |
| 2022.06.08. 09:00 | 0 |
| 2022.06.08. 09:15 | 0 |
| 2022.06.08. 09:30 | 0 |
| 2022.06.08. 09:45 | 0 |
| 2022.06.08. 10:00 | 0 |
| 2022.06.08. 10:15 | 0 |
| 2022.06.08. 10:30 | 0 |
| 2022.06.08. 10:45 | 0 |
| 2022.06.08. 11:00 | 0 |
| 2022.06.08. 11:15 | 0 |
| 2022.06.08. 11:30 | 0 |
| 2022.06.08. 11:45 | 0 |
| 2022.06.08. 12:00 | 0 |
| 2022.06.08. 12:15 | 0 |
| 2022.06.08. 12:30 | 0 |
| 2022.06.08. 12:45 | 0 |
| 2022.06.08. 13:00 | 0 |
| 2022.06.08. 13:15 | 0 |
| 2022.06.08. 13:30 | 0 |
| 2022.06.08. 13:45 | 0 |
| 2022.06.08. 14:00 | 0 |
| 2022.06.08. 14:15 | 0 |
| 2022.06.08. 14:30 | 0 |
| 2022.06.08. 14:45 | 0 |
| 2022.06.08. 15:00 | 0 |
| 2022.06.08. 15:15 | 0 |
| 2022.06.08. 15:30 | 0 |
| 2022.06.08. 15:45 | 0 |
| 2022.06.08. 16:00 | 0 |
| 2022.06.08. 16:15 | 0 |
| 2022.06.08. 16:30 | 0 |
| 2022.06.08. 16:45 | 0 |
| 2022.06.08. 17:00 | 0 |
| 2022.06.08. 17:15 | 0 |
| 2022.06.08. 17:30 | 0 |
| 2022.06.08. 17:45 | 0 |
| 2022.06.08. 18:00 | 0 |
| 2022.06.08. 18:15 | 0 |
| 2022.06.08. 18:30 | 0 |
| 2022.06.08. 18:45 | 0 |
| 2022.06.08. 19:00 | 0 |
| 2022.06.08. 19:15 | 0 |
| 2022.06.08. 19:30 | 0 |
| 2022.06.08. 19:45 | 0 |
| 2022.06.08. 20:00 | 0 |
| 2022.06.08. 20:15 | 0 |
| 2022.06.08. 20:30 | 0 |
| 2022.06.08. 20:45 | 0 |
| 2022.06.08. 21:00 | 0 |
| 2022.06.08. 21:15 | 0 |
| 2022.06.08. 21:30 | 0 |
| 2022.06.08. 21:45 | 0 |
| 2022.06.08. 22:00 | 0 |
| 2022.06.08. 22:15 | 0 |
| 2022.06.08. 22:30 | 0 |
| 2022.06.08. 22:45 | 0 |
| 2022.06.08. 23:00 | 0 |
| 2022.06.08. 23:15 | 0 |
| 2022.06.08. 23:30 | 0 |
| 2022.06.08. 23:45 | 0 |
| 2022.06.09. 00:00 | 0 |
| 2022.06.09. 00:15 | 0 |
| 2022.06.09. 00:30 | 0 |
| 2022.06.09. 00:45 | 0 |
| 2022.06.09. 01:00 | 0 |
| 2022.06.09. 01:15 | 0 |
| 2022.06.09. 01:30 | 0 |
| 2022.06.09. 01:45 | 0 |
| 2022.06.09. 02:00 | 0 |
| 2022.06.09. 02:15 | 0 |
| 2022.06.09. 02:30 | 0 |
| 2022.06.09. 02:45 | 0 |
| 2022.06.09. 03:00 | 0 |
| 2022.06.09. 03:15 | 0 |
| 2022.06.09. 03:30 | 0 |
| 2022.06.09. 03:45 | 0 |
| 2022.06.09. 04:00 | 0 |
| 2022.06.09. 04:15 | 0 |
| 2022.06.09. 04:30 | 0 |
| 2022.06.09. 04:45 | 0 |
| 2022.06.09. 05:00 | 0 |
| 2022.06.09. 05:15 | 0 |
| 2022.06.09. 05:30 | 0 |
| 2022.06.09. 05:45 | 0 |
| 2022.06.09. 06:00 | 0 |
| 2022.06.09. 06:15 | 0 |
| 2022.06.09. 06:30 | 0 |
| 2022.06.09. 06:45 | 0 |
| 2022.06.09. 07:00 | 0 |
| 2022.06.09. 07:15 | 0 |
| 2022.06.09. 07:30 | 0 |
| 2022.06.09. 07:45 | 0 |
| 2022.06.09. 08:00 | 0 |
| 2022.06.09. 08:15 | 0 |
| 2022.06.09. 08:30 | 0 |
| 2022.06.09. 08:45 | 0 |
| 2022.06.09. 09:00 | 0 |
| 2022.06.09. 09:15 | 0 |
| 2022.06.09. 09:30 | 0 |
| 2022.06.09. 09:45 | 0 |
| 2022.06.09. 10:00 | 0 |
| 2022.06.09. 10:15 | 0 |
| 2022.06.09. 10:30 | 0 |
| 2022.06.09. 10:45 | 0 |
| 2022.06.09. 11:00 | 0 |
| 2022.06.09. 11:15 | 0 |
| 2022.06.09. 11:30 | 0 |
| 2022.06.09. 11:45 | 0 |
| 2022.06.09. 12:00 | 0 |
| 2022.06.09. 12:15 | 0 |
| 2022.06.09. 12:30 | 0 |
| 2022.06.09. 12:45 | 0 |
| 2022.06.09. 13:00 | 0 |
| 2022.06.09. 13:15 | 0 |
| 2022.06.09. 13:30 | 0 |
| 2022.06.09. 13:45 | 0 |
| 2022.06.09. 14:00 | 0 |
| 2022.06.09. 14:15 | 0 |
| 2022.06.09. 14:30 | 0 |
| 2022.06.09. 14:45 | 0 |
| 2022.06.09. 15:00 | 0 |
| 2022.06.09. 15:15 | 0 |
| 2022.06.09. 15:30 | 0 |
| 2022.06.09. 15:45 | 0 |
| 2022.06.09. 16:00 | 0 |
| 2022.06.09. 16:15 | 0 |
| 2022.06.09. 16:30 | 0 |
| 2022.06.09. 16:45 | 0 |
| 2022.06.09. 17:00 | 0 |
| 2022.06.09. 17:15 | 0 |
| 2022.06.09. 17:30 | 0 |
| 2022.06.09. 17:45 | 0 |
| 2022.06.09. 18:00 | 0 |
| 2022.06.09. 18:15 | 0 |
| 2022.06.09. 18:30 | 0 |
| 2022.06.09. 18:45 | 0 |
| 2022.06.09. 19:00 | 0 |
| 2022.06.09. 19:15 | 0 |
| 2022.06.09. 19:30 | 0 |
| 2022.06.09. 19:45 | 0 |
| 2022.06.09. 20:00 | 0 |
| 2022.06.09. 20:15 | 0 |
| 2022.06.09. 20:30 | 0 |
| 2022.06.09. 20:45 | 0 |
| 2022.06.09. 21:00 | 0 |
| 2022.06.09. 21:15 | 0 |
| 2022.06.09. 21:30 | 0 |
| 2022.06.09. 21:45 | 0 |
| 2022.06.09. 22:00 | 0 |
| 2022.06.09. 22:15 | 0 |
| 2022.06.09. 22:30 | 0 |
| 2022.06.09. 22:45 | 0 |
| 2022.06.09. 23:00 | 0 |
| 2022.06.09. 23:15 | 0 |
| 2022.06.09. 23:30 | 0 |
| 2022.06.09. 23:45 | 0 |
| 2022.06.10. 00:00 | 0 |
| 2022.06.10. 00:15 | 0 |
| 2022.06.10. 00:30 | 0 |
| 2022.06.10. 00:45 | 0 |
| 2022.06.10. 01:00 | 0 |
| 2022.06.10. 01:15 | 0 |
| 2022.06.10. 01:30 | 0 |
| 2022.06.10. 01:45 | 0 |
| 2022.06.10. 02:00 | 0 |
| 2022.06.10. 02:15 | 0 |
| 2022.06.10. 02:30 | 0 |
| 2022.06.10. 02:45 | 0 |
| 2022.06.10. 03:00 | 0 |
| 2022.06.10. 03:15 | 0 |
| 2022.06.10. 03:30 | 0 |
| 2022.06.10. 03:45 | 0 |
| 2022.06.10. 04:00 | 0 |
| 2022.06.10. 04:15 | 0 |
| 2022.06.10. 04:30 | 0 |
| 2022.06.10. 04:45 | 0 |
| 2022.06.10. 05:00 | 0 |
| 2022.06.10. 05:15 | 0 |
| 2022.06.10. 05:30 | 0 |
| 2022.06.10. 05:45 | 0 |
| 2022.06.10. 06:00 | 0 |
| 2022.06.10. 06:15 | 0 |
| 2022.06.10. 06:30 | 0 |
| 2022.06.10. 06:45 | 0 |
| 2022.06.10. 07:00 | 0 |
| 2022.06.10. 07:15 | 0 |
| 2022.06.10. 07:30 | 0 |
| 2022.06.10. 07:45 | 0 |
| 2022.06.10. 08:00 | 0 |
| 2022.06.10. 08:15 | 0 |
| 2022.06.10. 08:30 | 0 |
| 2022.06.10. 08:45 | 0 |
| 2022.06.10. 09:00 | 0 |
| 2022.06.10. 09:15 | 0 |
| 2022.06.10. 09:30 | 0 |
| 2022.06.10. 09:45 | 0 |
| 2022.06.10. 10:00 | 0 |
| 2022.06.10. 10:15 | 0 |
| 2022.06.10. 10:30 | 0 |
| 2022.06.10. 10:45 | 0 |
| 2022.06.10. 11:00 | 0 |
| 2022.06.10. 11:15 | 0 |
| 2022.06.10. 11:30 | 0 |
| 2022.06.10. 11:45 | 0 |
| 2022.06.10. 12:00 | 0 |
| 2022.06.10. 12:15 | 0 |
| 2022.06.10. 12:30 | 0 |
| 2022.06.10. 12:45 | 0 |
| 2022.06.10. 13:00 | 0 |
| 2022.06.10. 13:15 | 0 |
| 2022.06.10. 13:30 | 0 |
| 2022.06.10. 13:45 | 0 |
| 2022.06.10. 14:00 | 0 |
| 2022.06.10. 14:15 | 0 |
| 2022.06.10. 14:30 | 0 |
| 2022.06.10. 14:45 | 0 |
| 2022.06.10. 15:00 | 0 |
| 2022.06.10. 15:15 | 0 |
| 2022.06.10. 15:30 | 0 |
| 2022.06.10. 15:45 | 0 |
| 2022.06.10. 16:00 | 0 |
| 2022.06.10. 16:15 | 0 |
| 2022.06.10. 16:30 | 0 |
| 2022.06.10. 16:45 | 0 |
| 2022.06.10. 17:00 | 0 |
| 2022.06.10. 17:15 | 0 |
| 2022.06.10. 17:30 | 0 |
| 2022.06.10. 17:45 | 0 |
| 2022.06.10. 18:00 | 0 |
| 2022.06.10. 18:15 | 0 |
| 2022.06.10. 18:30 | 0 |
| 2022.06.10. 18:45 | 0 |
| 2022.06.10. 19:00 | 0 |
| 2022.06.10. 19:15 | 0 |
| 2022.06.10. 19:30 | 0 |
| 2022.06.10. 19:45 | 0 |
| 2022.06.10. 20:00 | 0 |
| 2022.06.10. 20:15 | 0 |
| 2022.06.10. 20:30 | 0 |
| 2022.06.10. 20:45 | 0 |
| 2022.06.10. 21:00 | 0 |
| 2022.06.10. 21:15 | 0 |
| 2022.06.10. 21:30 | 0 |
| 2022.06.10. 21:45 | 0 |
| 2022.06.10. 22:00 | 0 |
| 2022.06.10. 22:15 | 0 |
| 2022.06.10. 22:30 | 0 |
| 2022.06.10. 22:45 | 0 |
| 2022.06.10. 23:00 | 0 |
| 2022.06.10. 23:15 | 0 |
| 2022.06.10. 23:30 | 0 |
| 2022.06.10. 23:45 | 0 |
| 2022.06.11. 00:00 | 0 |
| 2022.06.11. 00:15 | 0 |
| 2022.06.11. 00:30 | 0 |
| 2022.06.11. 00:45 | 0 |
| 2022.06.11. 01:00 | 0 |
| 2022.06.11. 01:15 | 0 |
| 2022.06.11. 01:30 | 0 |
| 2022.06.11. 01:45 | 0 |
| 2022.06.11. 02:00 | 0 |
| 2022.06.11. 02:15 | 0 |
| 2022.06.11. 02:30 | 0 |
| 2022.06.11. 02:45 | 0 |
| 2022.06.11. 03:00 | 0 |
| 2022.06.11. 03:15 | 0 |
| 2022.06.11. 03:30 | 0 |
| 2022.06.11. 03:45 | 0 |
| 2022.06.11. 04:00 | 0 |
| 2022.06.11. 04:15 | 0 |
| 2022.06.11. 04:30 | 0 |
| 2022.06.11. 04:45 | 0 |
| 2022.06.11. 05:00 | 0 |
| 2022.06.11. 05:15 | 0 |
| 2022.06.11. 05:30 | 0 |
| 2022.06.11. 05:45 | 0 |
| 2022.06.11. 06:00 | 0 |
| 2022.06.11. 06:15 | 0 |
| 2022.06.11. 06:30 | 0 |
| 2022.06.11. 06:45 | 0 |
| 2022.06.11. 07:00 | 0 |
| 2022.06.11. 07:15 | 0 |
| 2022.06.11. 07:30 | 0 |
| 2022.06.11. 07:45 | 0 |
| 2022.06.11. 08:00 | 0 |
| 2022.06.11. 08:15 | 0 |
| 2022.06.11. 08:30 | 0 |
| 2022.06.11. 08:45 | 0 |
| 2022.06.11. 09:00 | 0 |
| 2022.06.11. 09:15 | 0 |
| 2022.06.11. 09:30 | 0 |
| 2022.06.11. 09:45 | 0 |
| 2022.06.11. 10:00 | 0 |
| 2022.06.11. 10:15 | 0 |
| 2022.06.11. 10:30 | 0 |
| 2022.06.11. 10:45 | 0 |
| 2022.06.11. 11:00 | 0 |
| 2022.06.11. 11:15 | 0 |
| 2022.06.11. 11:30 | 0 |
| 2022.06.11. 11:45 | 0 |
| 2022.06.11. 12:00 | 0 |
| 2022.06.11. 12:15 | 0 |
| 2022.06.11. 12:30 | 0 |
| 2022.06.11. 12:45 | 0 |
| 2022.06.11. 13:00 | 0 |
| 2022.06.11. 13:15 | 0 |
| 2022.06.11. 13:30 | 0 |
| 2022.06.11. 13:45 | 0 |
| 2022.06.11. 14:00 | 0 |
| 2022.06.11. 14:15 | 0 |
| 2022.06.11. 14:30 | 0 |
| 2022.06.11. 14:45 | 0 |
| 2022.06.11. 15:00 | 0 |
| 2022.06.11. 15:15 | 0 |
| 2022.06.11. 15:30 | 0 |
| 2022.06.11. 15:45 | 0 |
| 2022.06.11. 16:00 | 0 |
| 2022.06.11. 16:15 | 0 |
| 2022.06.11. 16:30 | 0 |
| 2022.06.11. 16:45 | 0 |
| 2022.06.11. 17:00 | 0 |
| 2022.06.11. 17:15 | 0 |
| 2022.06.11. 17:30 | 0 |
| 2022.06.11. 17:45 | 0 |
| 2022.06.11. 18:00 | 0 |
| 2022.06.11. 18:15 | 0 |
| 2022.06.11. 18:30 | 0 |
| 2022.06.11. 18:45 | 0 |
| 2022.06.11. 19:00 | 0 |
| 2022.06.11. 19:15 | 0 |
| 2022.06.11. 19:30 | 0 |
| 2022.06.11. 19:45 | 0 |
| 2022.06.11. 20:00 | 0 |
| 2022.06.11. 20:15 | 0 |
| 2022.06.11. 20:30 | 0 |
| 2022.06.11. 20:45 | 0 |
| 2022.06.11. 21:00 | 0 |
| 2022.06.11. 21:15 | 0 |
| 2022.06.11. 21:30 | 0 |
| 2022.06.11. 21:45 | 0 |
| 2022.06.11. 22:00 | 0 |
| 2022.06.11. 22:15 | 0 |
| 2022.06.11. 22:30 | 0 |
| 2022.06.11. 22:45 | 0 |
| 2022.06.11. 23:00 | 0 |
| 2022.06.11. 23:15 | 0 |
| 2022.06.11. 23:30 | 0 |
| 2022.06.11. 23:45 | 0 |
| 2022.06.12. 00:00 | 0 |
| 2022.06.12. 00:15 | 0 |
| 2022.06.12. 00:30 | 0 |
| 2022.06.12. 00:45 | 0 |
| 2022.06.12. 01:00 | 0 |
| 2022.06.12. 01:15 | 0 |
| 2022.06.12. 01:30 | 0 |
| 2022.06.12. 01:45 | 0 |
| 2022.06.12. 02:00 | 0 |
| 2022.06.12. 02:15 | 0 |
| 2022.06.12. 02:30 | 0 |
| 2022.06.12. 02:45 | 0 |
| 2022.06.12. 03:00 | 0 |
| 2022.06.12. 03:15 | 0 |
| 2022.06.12. 03:30 | 0 |
| 2022.06.12. 03:45 | 0 |
| 2022.06.12. 04:00 | 0 |
| 2022.06.12. 04:15 | 0 |
| 2022.06.12. 04:30 | 0 |
| 2022.06.12. 04:45 | 0 |
| 2022.06.12. 05:00 | 0 |
| 2022.06.12. 05:15 | 0 |
| 2022.06.12. 05:30 | 0 |
| 2022.06.12. 05:45 | 0 |
| 2022.06.12. 06:00 | 0 |
| 2022.06.12. 06:15 | 0 |
| 2022.06.12. 06:30 | 0 |
| 2022.06.12. 06:45 | 0 |
| 2022.06.12. 07:00 | 0 |
| 2022.06.12. 07:15 | 0 |
| 2022.06.12. 07:30 | 0 |
| 2022.06.12. 07:45 | 0 |
| 2022.06.12. 08:00 | 0 |
| 2022.06.12. 08:15 | 0 |
| 2022.06.12. 08:30 | 0 |
| 2022.06.12. 08:45 | 0 |
| 2022.06.12. 09:00 | 0 |
| 2022.06.12. 09:15 | 0 |
| 2022.06.12. 09:30 | 0 |
| 2022.06.12. 09:45 | 0 |
| 2022.06.12. 10:00 | 0 |
| 2022.06.12. 10:15 | 0 |
| 2022.06.12. 10:30 | 0 |
| 2022.06.12. 10:45 | 0 |
| 2022.06.12. 11:00 | 0 |
| 2022.06.12. 11:15 | 0 |
| 2022.06.12. 11:30 | 0 |
| 2022.06.12. 11:45 | 0 |
| 2022.06.12. 12:00 | 0 |
| 2022.06.12. 12:15 | 0 |
| 2022.06.12. 12:30 | 0 |
| 2022.06.12. 12:45 | 0 |
| 2022.06.12. 13:00 | 0 |
| 2022.06.12. 13:15 | 0 |
| 2022.06.12. 13:30 | 0 |
| 2022.06.12. 13:45 | 0 |
| 2022.06.12. 14:00 | 0 |
| 2022.06.12. 14:15 | 0 |
| 2022.06.12. 14:30 | 0 |
| 2022.06.12. 14:45 | 0 |
| 2022.06.12. 15:00 | 0 |
| 2022.06.12. 15:15 | 0 |
| 2022.06.12. 15:30 | 0 |
| 2022.06.12. 15:45 | 0 |
| 2022.06.12. 16:00 | 0 |
| 2022.06.12. 16:15 | 0 |
| 2022.06.12. 16:30 | 0 |
| 2022.06.12. 16:45 | 0 |
| 2022.06.12. 17:00 | 0 |
| 2022.06.12. 17:15 | 0 |
| 2022.06.12. 17:30 | 0 |
| 2022.06.12. 17:45 | 0 |
| 2022.06.12. 18:00 | 0 |
| 2022.06.12. 18:15 | 0 |
| 2022.06.12. 18:30 | 0 |
| 2022.06.12. 18:45 | 0 |
| 2022.06.12. 19:00 | 0 |
| 2022.06.12. 19:15 | 0 |
| 2022.06.12. 19:30 | 0 |
| 2022.06.12. 19:45 | 0 |
| 2022.06.12. 20:00 | 0 |
| 2022.06.12. 20:15 | 0 |
| 2022.06.12. 20:30 | 0 |
| 2022.06.12. 20:45 | 0 |
| 2022.06.12. 21:00 | 0 |
| 2022.06.12. 21:15 | 0 |
| 2022.06.12. 21:30 | 0 |
| 2022.06.12. 21:45 | 0 |
| 2022.06.12. 22:00 | 0 |
| 2022.06.12. 22:15 | 0 |
| 2022.06.12. 22:30 | 0 |
| 2022.06.12. 22:45 | 0 |
| 2022.06.12. 23:00 | 0 |
| 2022.06.12. 23:15 | 0 |
| 2022.06.12. 23:30 | 0 |
| 2022.06.12. 23:45 | 0 |
| 2022.06.13. 00:00 | 0 |
| 2022.06.13. 00:15 | 0 |
| 2022.06.13. 00:30 | 0 |
| 2022.06.13. 00:45 | 0 |
| 2022.06.13. 01:00 | 0 |
| 2022.06.13. 01:15 | 0 |
| 2022.06.13. 01:30 | 0 |
| 2022.06.13. 01:45 | 0 |
| 2022.06.13. 02:00 | 0 |
| 2022.06.13. 02:15 | 0 |
| 2022.06.13. 02:30 | 0 |
| 2022.06.13. 02:45 | 0 |
| 2022.06.13. 03:00 | 0 |
| 2022.06.13. 03:15 | 0 |
| 2022.06.13. 03:30 | 0 |
| 2022.06.13. 03:45 | 0 |
| 2022.06.13. 04:00 | 0 |
| 2022.06.13. 04:15 | 0 |
| 2022.06.13. 04:30 | 0 |
| 2022.06.13. 04:45 | 0 |
| 2022.06.13. 05:00 | 0 |
| 2022.06.13. 05:15 | 0 |
| 2022.06.13. 05:30 | 0 |
| 2022.06.13. 05:45 | 0 |
| 2022.06.13. 06:00 | 0 |
| 2022.06.13. 06:15 | 0 |
| 2022.06.13. 06:30 | 0 |
| 2022.06.13. 06:45 | 0 |
| 2022.06.13. 07:00 | 0 |
| 2022.06.13. 07:15 | 0 |
| 2022.06.13. 07:30 | 0 |
| 2022.06.13. 07:45 | 0 |
| 2022.06.13. 08:00 | 0 |
| 2022.06.13. 08:15 | 0 |
| 2022.06.13. 08:30 | 0 |
| 2022.06.13. 08:45 | 0 |
| 2022.06.13. 09:00 | 0 |
| 2022.06.13. 09:15 | 0 |
| 2022.06.13. 09:30 | 0 |
| 2022.06.13. 09:45 | 0 |
| 2022.06.13. 10:00 | 0 |
| 2022.06.13. 10:15 | 0 |
| 2022.06.13. 10:30 | 0 |
| 2022.06.13. 10:45 | 0 |
| 2022.06.13. 11:00 | 0 |
| 2022.06.13. 11:15 | 0 |
| 2022.06.13. 11:30 | 0 |
| 2022.06.13. 11:45 | 0 |
| 2022.06.13. 12:00 | 0 |
| 2022.06.13. 12:15 | 0 |
| 2022.06.13. 12:30 | 0 |
| 2022.06.13. 12:45 | 0 |
| 2022.06.13. 13:00 | 0 |
| 2022.06.13. 13:15 | 0 |
| 2022.06.13. 13:30 | 0 |
| 2022.06.13. 13:45 | 0 |
| 2022.06.13. 14:00 | 0 |
| 2022.06.13. 14:15 | 0 |
| 2022.06.13. 14:30 | 0 |
| 2022.06.13. 14:45 | 0 |
| 2022.06.13. 15:00 | 0 |
| 2022.06.13. 15:15 | 0 |
| 2022.06.13. 15:30 | 0 |
| 2022.06.13. 15:45 | 0 |
| 2022.06.13. 16:00 | 0 |
| 2022.06.13. 16:15 | 0 |
| 2022.06.13. 16:30 | 0 |
| 2022.06.13. 16:45 | 0 |
| 2022.06.13. 17:00 | 0 |
| 2022.06.13. 17:15 | 0 |
| 2022.06.13. 17:30 | 0 |
| 2022.06.13. 17:45 | 0 |
| 2022.06.13. 18:00 | 0 |
| 2022.06.13. 18:15 | 0 |
| 2022.06.13. 18:30 | 0 |
| 2022.06.13. 18:45 | 0 |
| 2022.06.13. 19:00 | 0 |
| 2022.06.13. 19:15 | 0 |
| 2022.06.13. 19:30 | 0 |
| 2022.06.13. 19:45 | 0 |
| 2022.06.13. 20:00 | 0 |
| 2022.06.13. 20:15 | 0 |
| 2022.06.13. 20:30 | 0 |
| 2022.06.13. 20:45 | 0 |
| 2022.06.13. 21:00 | 0 |
| 2022.06.13. 21:15 | 0 |
| 2022.06.13. 21:30 | 0 |
| 2022.06.13. 21:45 | 0 |
| 2022.06.13. 22:00 | 0 |
| 2022.06.13. 22:15 | 0 |
| 2022.06.13. 22:30 | 0 |
| 2022.06.13. 22:45 | 0 |
| 2022.06.13. 23:00 | 0 |
| 2022.06.13. 23:15 | 0 |
| 2022.06.13. 23:30 | 0 |
| 2022.06.13. 23:45 | 0 |
| 2022.06.14. 00:00 | 0 |
| 2022.06.14. 00:15 | 0 |
| 2022.06.14. 00:30 | 0 |
| 2022.06.14. 00:45 | 0 |
| 2022.06.14. 01:00 | 0 |
| 2022.06.14. 01:15 | 0 |
| 2022.06.14. 01:30 | 0 |
| 2022.06.14. 01:45 | 0 |
| 2022.06.14. 02:00 | 0 |
| 2022.06.14. 02:15 | 0 |
| 2022.06.14. 02:30 | 0 |
| 2022.06.14. 02:45 | 0 |
| 2022.06.14. 03:00 | 0 |
| 2022.06.14. 03:15 | 0 |
| 2022.06.14. 03:30 | 0 |
| 2022.06.14. 03:45 | 0 |
| 2022.06.14. 04:00 | 0 |
| 2022.06.14. 04:15 | 0 |
| 2022.06.14. 04:30 | 0 |
| 2022.06.14. 04:45 | 0 |
| 2022.06.14. 05:00 | 0 |
| 2022.06.14. 05:15 | 0 |
| 2022.06.14. 05:30 | 0 |
| 2022.06.14. 05:45 | 0 |
| 2022.06.14. 06:00 | 0 |
| 2022.06.14. 06:15 | 0 |
| 2022.06.14. 06:30 | 0 |
| 2022.06.14. 06:45 | 0 |
| 2022.06.14. 07:00 | 0 |
| 2022.06.14. 07:15 | 0 |
| 2022.06.14. 07:30 | 0 |
| 2022.06.14. 07:45 | 0 |
| 2022.06.14. 08:00 | 0 |
| 2022.06.14. 08:15 | 0 |
| 2022.06.14. 08:30 | 0 |
| 2022.06.14. 08:45 | 0 |
| 2022.06.14. 09:00 | 0 |
| 2022.06.14. 09:15 | 0 |
| 2022.06.14. 09:30 | 0 |
| 2022.06.14. 09:45 | 0 |
| 2022.06.14. 10:00 | 0 |
| 2022.06.14. 10:15 | 0 |
| 2022.06.14. 10:30 | 0 |
| 2022.06.14. 10:45 | 0 |
| 2022.06.14. 11:00 | 0 |
| 2022.06.14. 11:15 | 0 |
| 2022.06.14. 11:30 | 0 |
| 2022.06.14. 11:45 | 0 |
| 2022.06.14. 12:00 | 0 |
| 2022.06.14. 12:15 | 0 |
| 2022.06.14. 12:30 | 0 |
| 2022.06.14. 12:45 | 0 |
| 2022.06.14. 13:00 | 0 |
| 2022.06.14. 13:15 | 0 |
| 2022.06.14. 13:30 | 0 |
| 2022.06.14. 13:45 | 0 |
| 2022.06.14. 14:00 | 0 |
| 2022.06.14. 14:15 | 0 |
| 2022.06.14. 14:30 | 0 |
| 2022.06.14. 14:45 | 0 |
| 2022.06.14. 15:00 | 0 |
| 2022.06.14. 15:15 | 0 |
| 2022.06.14. 15:30 | 0 |
| 2022.06.14. 15:45 | 0 |
| 2022.06.14. 16:00 | 0 |
| 2022.06.14. 16:15 | 0 |
| 2022.06.14. 16:30 | 0 |
| 2022.06.14. 16:45 | 0 |
| 2022.06.14. 17:00 | 0 |
| 2022.06.14. 17:15 | 0 |
| 2022.06.14. 17:30 | 0 |
| 2022.06.14. 17:45 | 0 |
| 2022.06.14. 18:00 | 0 |
| 2022.06.14. 18:15 | 0 |
| 2022.06.14. 18:30 | 0 |
| 2022.06.14. 18:45 | 0 |
| 2022.06.14. 19:00 | 0 |
| 2022.06.14. 19:15 | 0 |
| 2022.06.14. 19:30 | 0 |
| 2022.06.14. 19:45 | 0 |
| 2022.06.14. 20:00 | 0 |
| 2022.06.14. 20:15 | 0 |
| 2022.06.14. 20:30 | 0 |
| 2022.06.14. 20:45 | 0 |
| 2022.06.14. 21:00 | 0 |
| 2022.06.14. 21:15 | 0 |
| 2022.06.14. 21:30 | 0 |
| 2022.06.14. 21:45 | 0 |
| 2022.06.14. 22:00 | 0 |
| 2022.06.14. 22:15 | 0 |
| 2022.06.14. 22:30 | 0 |
| 2022.06.14. 22:45 | 0 |
| 2022.06.14. 23:00 | 0 |
| 2022.06.14. 23:15 | 0 |
| 2022.06.14. 23:30 | 0 |
| 2022.06.14. 23:45 | 0 |
| 2022.06.15. 00:00 | 8 |
| 2022.06.15. 00:15 | 8 |
| 2022.06.15. 00:30 | 8 |
| 2022.06.15. 00:45 | 8 |
| 2022.06.15. 01:00 | 8 |
| 2022.06.15. 01:15 | 8 |
| 2022.06.15. 01:30 | 8 |
| 2022.06.15. 01:45 | 8 |
| 2022.06.15. 02:00 | 8 |
| 2022.06.15. 02:15 | 8 |
| 2022.06.15. 02:30 | 8 |
| 2022.06.15. 02:45 | 8 |
| 2022.06.15. 03:00 | 8 |
| 2022.06.15. 03:15 | 8 |
| 2022.06.15. 03:30 | 8 |
| 2022.06.15. 03:45 | 8 |
| 2022.06.15. 04:00 | 8 |
| 2022.06.15. 04:15 | 8 |
| 2022.06.15. 04:30 | 8 |
| 2022.06.15. 04:45 | 8 |
| 2022.06.15. 05:00 | 8 |
| 2022.06.15. 05:15 | 8 |
| 2022.06.15. 05:30 | 8 |
| 2022.06.15. 05:45 | 8 |
| 2022.06.15. 06:00 | 8 |
| 2022.06.15. 06:15 | 8 |
| 2022.06.15. 06:30 | 8 |
| 2022.06.15. 06:45 | 8 |
| 2022.06.15. 07:00 | 8 |
| 2022.06.15. 07:15 | 8 |
| 2022.06.15. 07:30 | 8 |
| 2022.06.15. 07:45 | 8 |
| 2022.06.15. 08:00 | 8 |
| 2022.06.15. 08:15 | 8 |
| 2022.06.15. 08:30 | 8 |
| 2022.06.15. 08:45 | 8 |
| 2022.06.15. 09:00 | 8 |
| 2022.06.15. 09:15 | 8 |
| 2022.06.15. 09:30 | 8 |
| 2022.06.15. 09:45 | 8 |
| 2022.06.15. 10:00 | 8 |
| 2022.06.15. 10:15 | 8 |
| 2022.06.15. 10:30 | 8 |
| 2022.06.15. 10:45 | 8 |
| 2022.06.15. 11:00 | 8 |
| 2022.06.15. 11:15 | 8 |
| 2022.06.15. 11:30 | 8 |
| 2022.06.15. 11:45 | 8 |
| 2022.06.15. 12:00 | 8 |
| 2022.06.15. 12:15 | 8 |
| 2022.06.15. 12:30 | 8 |
| 2022.06.15. 12:45 | 8 |
| 2022.06.15. 13:00 | 8 |
| 2022.06.15. 13:15 | 8 |
| 2022.06.15. 13:30 | 8 |
| 2022.06.15. 13:45 | 8 |
| 2022.06.15. 14:00 | 8 |
| 2022.06.15. 14:15 | 8 |
| 2022.06.15. 14:30 | 8 |
| 2022.06.15. 14:45 | 8 |
| 2022.06.15. 15:00 | 8 |
| 2022.06.15. 15:15 | 8 |
| 2022.06.15. 15:30 | 8 |
| 2022.06.15. 15:45 | 8 |
| 2022.06.15. 16:00 | 8 |
| 2022.06.15. 16:15 | 8 |
| 2022.06.15. 16:30 | 8 |
| 2022.06.15. 16:45 | 8 |
| 2022.06.15. 17:00 | 8 |
| 2022.06.15. 17:15 | 8 |
| 2022.06.15. 17:30 | 8 |
| 2022.06.15. 17:45 | 8 |
| 2022.06.15. 18:00 | 8 |
| 2022.06.15. 18:15 | 8 |
| 2022.06.15. 18:30 | 8 |
| 2022.06.15. 18:45 | 8 |
| 2022.06.15. 19:00 | 8 |
| 2022.06.15. 19:15 | 8 |
| 2022.06.15. 19:30 | 8 |
| 2022.06.15. 19:45 | 8 |
| 2022.06.15. 20:00 | 8 |
| 2022.06.15. 20:15 | 8 |
| 2022.06.15. 20:30 | 8 |
| 2022.06.15. 20:45 | 8 |
| 2022.06.15. 21:00 | 8 |
| 2022.06.15. 21:15 | 8 |
| 2022.06.15. 21:30 | 8 |
| 2022.06.15. 21:45 | 8 |
| 2022.06.15. 22:00 | 8 |
| 2022.06.15. 22:15 | 8 |
| 2022.06.15. 22:30 | 8 |
| 2022.06.15. 22:45 | 8 |
| 2022.06.15. 23:00 | 8 |
| 2022.06.15. 23:15 | 8 |
| 2022.06.15. 23:30 | 8 |
| 2022.06.15. 23:45 | 8 |
| 2022.06.16. 00:00 | 17 |
| 2022.06.16. 00:15 | 17 |
| 2022.06.16. 00:30 | 17 |
| 2022.06.16. 00:45 | 17 |
| 2022.06.16. 01:00 | 17 |
| 2022.06.16. 01:15 | 17 |
| 2022.06.16. 01:30 | 17 |
| 2022.06.16. 01:45 | 17 |
| 2022.06.16. 02:00 | 17 |
| 2022.06.16. 02:15 | 17 |
| 2022.06.16. 02:30 | 17 |
| 2022.06.16. 02:45 | 17 |
| 2022.06.16. 03:00 | 17 |
| 2022.06.16. 03:15 | 17 |
| 2022.06.16. 03:30 | 17 |
| 2022.06.16. 03:45 | 17 |
| 2022.06.16. 04:00 | 17 |
| 2022.06.16. 04:15 | 17 |
| 2022.06.16. 04:30 | 17 |
| 2022.06.16. 04:45 | 17 |
| 2022.06.16. 05:00 | 17 |
| 2022.06.16. 05:15 | 17 |
| 2022.06.16. 05:30 | 17 |
| 2022.06.16. 05:45 | 17 |
| 2022.06.16. 06:00 | 17 |
| 2022.06.16. 06:15 | 17 |
| 2022.06.16. 06:30 | 17 |
| 2022.06.16. 06:45 | 17 |
| 2022.06.16. 07:00 | 17 |
| 2022.06.16. 07:15 | 17 |
| 2022.06.16. 07:30 | 17 |
| 2022.06.16. 07:45 | 17 |
| 2022.06.16. 08:00 | 17 |
| 2022.06.16. 08:15 | 17 |
| 2022.06.16. 08:30 | 17 |
| 2022.06.16. 08:45 | 17 |
| 2022.06.16. 09:00 | 17 |
| 2022.06.16. 09:15 | 17 |
| 2022.06.16. 09:30 | 17 |
| 2022.06.16. 09:45 | 17 |
| 2022.06.16. 10:00 | 17 |
| 2022.06.16. 10:15 | 17 |
| 2022.06.16. 10:30 | 17 |
| 2022.06.16. 10:45 | 17 |
| 2022.06.16. 11:00 | 17 |
| 2022.06.16. 11:15 | 17 |
| 2022.06.16. 11:30 | 17 |
| 2022.06.16. 11:45 | 17 |
| 2022.06.16. 12:00 | 17 |
| 2022.06.16. 12:15 | 17 |
| 2022.06.16. 12:30 | 17 |
| 2022.06.16. 12:45 | 17 |
| 2022.06.16. 13:00 | 17 |
| 2022.06.16. 13:15 | 17 |
| 2022.06.16. 13:30 | 17 |
| 2022.06.16. 13:45 | 17 |
| 2022.06.16. 14:00 | 17 |
| 2022.06.16. 14:15 | 17 |
| 2022.06.16. 14:30 | 17 |
| 2022.06.16. 14:45 | 17 |
| 2022.06.16. 15:00 | 17 |
| 2022.06.16. 15:15 | 17 |
| 2022.06.16. 15:30 | 17 |
| 2022.06.16. 15:45 | 17 |
| 2022.06.16. 16:00 | 17 |
| 2022.06.16. 16:15 | 17 |
| 2022.06.16. 16:30 | 17 |
| 2022.06.16. 16:45 | 17 |
| 2022.06.16. 17:00 | 17 |
| 2022.06.16. 17:15 | 17 |
| 2022.06.16. 17:30 | 17 |
| 2022.06.16. 17:45 | 17 |
| 2022.06.16. 18:00 | 17 |
| 2022.06.16. 18:15 | 17 |
| 2022.06.16. 18:30 | 17 |
| 2022.06.16. 18:45 | 17 |
| 2022.06.16. 19:00 | 17 |
| 2022.06.16. 19:15 | 17 |
| 2022.06.16. 19:30 | 17 |
| 2022.06.16. 19:45 | 17 |
| 2022.06.16. 20:00 | 17 |
| 2022.06.16. 20:15 | 17 |
| 2022.06.16. 20:30 | 17 |
| 2022.06.16. 20:45 | 17 |
| 2022.06.16. 21:00 | 17 |
| 2022.06.16. 21:15 | 17 |
| 2022.06.16. 21:30 | 17 |
| 2022.06.16. 21:45 | 17 |
| 2022.06.16. 22:00 | 17 |
| 2022.06.16. 22:15 | 17 |
| 2022.06.16. 22:30 | 17 |
| 2022.06.16. 22:45 | 17 |
| 2022.06.16. 23:00 | 17 |
| 2022.06.16. 23:15 | 17 |
| 2022.06.16. 23:30 | 17 |
| 2022.06.16. 23:45 | 17 |
| 2022.06.17. 00:00 | 17 |
| 2022.06.17. 00:15 | 17 |
| 2022.06.17. 00:30 | 17 |
| 2022.06.17. 00:45 | 17 |
| 2022.06.17. 01:00 | 17 |
| 2022.06.17. 01:15 | 17 |
| 2022.06.17. 01:30 | 17 |
| 2022.06.17. 01:45 | 17 |
| 2022.06.17. 02:00 | 17 |
| 2022.06.17. 02:15 | 17 |
| 2022.06.17. 02:30 | 17 |
| 2022.06.17. 02:45 | 17 |
| 2022.06.17. 03:00 | 17 |
| 2022.06.17. 03:15 | 17 |
| 2022.06.17. 03:30 | 17 |
| 2022.06.17. 03:45 | 17 |
| 2022.06.17. 04:00 | 17 |
| 2022.06.17. 04:15 | 17 |
| 2022.06.17. 04:30 | 17 |
| 2022.06.17. 04:45 | 17 |
| 2022.06.17. 05:00 | 17 |
| 2022.06.17. 05:15 | 17 |
| 2022.06.17. 05:30 | 17 |
| 2022.06.17. 05:45 | 17 |
| 2022.06.17. 06:00 | 17 |
| 2022.06.17. 06:15 | 17 |
| 2022.06.17. 06:30 | 17 |
| 2022.06.17. 06:45 | 17 |
| 2022.06.17. 07:00 | 17 |
| 2022.06.17. 07:15 | 17 |
| 2022.06.17. 07:30 | 17 |
| 2022.06.17. 07:45 | 17 |
| 2022.06.17. 08:00 | 17 |
| 2022.06.17. 08:15 | 17 |
| 2022.06.17. 08:30 | 17 |
| 2022.06.17. 08:45 | 17 |
| 2022.06.17. 09:00 | 17 |
| 2022.06.17. 09:15 | 17 |
| 2022.06.17. 09:30 | 17 |
| 2022.06.17. 09:45 | 17 |
| 2022.06.17. 10:00 | 17 |
| 2022.06.17. 10:15 | 17 |
| 2022.06.17. 10:30 | 17 |
| 2022.06.17. 10:45 | 17 |
| 2022.06.17. 11:00 | 17 |
| 2022.06.17. 11:15 | 17 |
| 2022.06.17. 11:30 | 17 |
| 2022.06.17. 11:45 | 17 |
| 2022.06.17. 12:00 | 17 |
| 2022.06.17. 12:15 | 17 |
| 2022.06.17. 12:30 | 17 |
| 2022.06.17. 12:45 | 17 |
| 2022.06.17. 13:00 | 17 |
| 2022.06.17. 13:15 | 17 |
| 2022.06.17. 13:30 | 17 |
| 2022.06.17. 13:45 | 17 |
| 2022.06.17. 14:00 | 17 |
| 2022.06.17. 14:15 | 17 |
| 2022.06.17. 14:30 | 17 |
| 2022.06.17. 14:45 | 17 |
| 2022.06.17. 15:00 | 17 |
| 2022.06.17. 15:15 | 17 |
| 2022.06.17. 15:30 | 17 |
| 2022.06.17. 15:45 | 17 |
| 2022.06.17. 16:00 | 17 |
| 2022.06.17. 16:15 | 17 |
| 2022.06.17. 16:30 | 17 |
| 2022.06.17. 16:45 | 17 |
| 2022.06.17. 17:00 | 17 |
| 2022.06.17. 17:15 | 17 |
| 2022.06.17. 17:30 | 17 |
| 2022.06.17. 17:45 | 17 |
| 2022.06.17. 18:00 | 17 |
| 2022.06.17. 18:15 | 17 |
| 2022.06.17. 18:30 | 17 |
| 2022.06.17. 18:45 | 17 |
| 2022.06.17. 19:00 | 17 |
| 2022.06.17. 19:15 | 17 |
| 2022.06.17. 19:30 | 17 |
| 2022.06.17. 19:45 | 17 |
| 2022.06.17. 20:00 | 17 |
| 2022.06.17. 20:15 | 17 |
| 2022.06.17. 20:30 | 17 |
| 2022.06.17. 20:45 | 17 |
| 2022.06.17. 21:00 | 17 |
| 2022.06.17. 21:15 | 17 |
| 2022.06.17. 21:30 | 17 |
| 2022.06.17. 21:45 | 17 |
| 2022.06.17. 22:00 | 17 |
| 2022.06.17. 22:15 | 17 |
| 2022.06.17. 22:30 | 17 |
| 2022.06.17. 22:45 | 17 |
| 2022.06.17. 23:00 | 17 |
| 2022.06.17. 23:15 | 17 |
| 2022.06.17. 23:30 | 17 |
| 2022.06.17. 23:45 | 17 |
| 2022.06.18. 00:00 | 17 |
| 2022.06.18. 00:15 | 17 |
| 2022.06.18. 00:30 | 17 |
| 2022.06.18. 00:45 | 17 |
| 2022.06.18. 01:00 | 17 |
| 2022.06.18. 01:15 | 17 |
| 2022.06.18. 01:30 | 17 |
| 2022.06.18. 01:45 | 17 |
| 2022.06.18. 02:00 | 17 |
| 2022.06.18. 02:15 | 17 |
| 2022.06.18. 02:30 | 17 |
| 2022.06.18. 02:45 | 17 |
| 2022.06.18. 03:00 | 17 |
| 2022.06.18. 03:15 | 17 |
| 2022.06.18. 03:30 | 17 |
| 2022.06.18. 03:45 | 17 |
| 2022.06.18. 04:00 | 17 |
| 2022.06.18. 04:15 | 17 |
| 2022.06.18. 04:30 | 17 |
| 2022.06.18. 04:45 | 17 |
| 2022.06.18. 05:00 | 17 |
| 2022.06.18. 05:15 | 17 |
| 2022.06.18. 05:30 | 17 |
| 2022.06.18. 05:45 | 17 |
| 2022.06.18. 06:00 | 17 |
| 2022.06.18. 06:15 | 17 |
| 2022.06.18. 06:30 | 17 |
| 2022.06.18. 06:45 | 17 |
| 2022.06.18. 07:00 | 17 |
| 2022.06.18. 07:15 | 17 |
| 2022.06.18. 07:30 | 17 |
| 2022.06.18. 07:45 | 17 |
| 2022.06.18. 08:00 | 17 |
| 2022.06.18. 08:15 | 17 |
| 2022.06.18. 08:30 | 17 |
| 2022.06.18. 08:45 | 17 |
| 2022.06.18. 09:00 | 17 |
| 2022.06.18. 09:15 | 17 |
| 2022.06.18. 09:30 | 17 |
| 2022.06.18. 09:45 | 17 |
| 2022.06.18. 10:00 | 17 |
| 2022.06.18. 10:15 | 17 |
| 2022.06.18. 10:30 | 17 |
| 2022.06.18. 10:45 | 17 |
| 2022.06.18. 11:00 | 17 |
| 2022.06.18. 11:15 | 17 |
| 2022.06.18. 11:30 | 17 |
| 2022.06.18. 11:45 | 17 |
| 2022.06.18. 12:00 | 17 |
| 2022.06.18. 12:15 | 17 |
| 2022.06.18. 12:30 | 17 |
| 2022.06.18. 12:45 | 17 |
| 2022.06.18. 13:00 | 17 |
| 2022.06.18. 13:15 | 17 |
| 2022.06.18. 13:30 | 17 |
| 2022.06.18. 13:45 | 17 |
| 2022.06.18. 14:00 | 17 |
| 2022.06.18. 14:15 | 17 |
| 2022.06.18. 14:30 | 17 |
| 2022.06.18. 14:45 | 17 |
| 2022.06.18. 15:00 | 17 |
| 2022.06.18. 15:15 | 17 |
| 2022.06.18. 15:30 | 17 |
| 2022.06.18. 15:45 | 17 |
| 2022.06.18. 16:00 | 17 |
| 2022.06.18. 16:15 | 17 |
| 2022.06.18. 16:30 | 17 |
| 2022.06.18. 16:45 | 17 |
| 2022.06.18. 17:00 | 17 |
| 2022.06.18. 17:15 | 17 |
| 2022.06.18. 17:30 | 17 |
| 2022.06.18. 17:45 | 17 |
| 2022.06.18. 18:00 | 17 |
| 2022.06.18. 18:15 | 17 |
| 2022.06.18. 18:30 | 17 |
| 2022.06.18. 18:45 | 17 |
| 2022.06.18. 19:00 | 17 |
| 2022.06.18. 19:15 | 17 |
| 2022.06.18. 19:30 | 17 |
| 2022.06.18. 19:45 | 17 |
| 2022.06.18. 20:00 | 17 |
| 2022.06.18. 20:15 | 17 |
| 2022.06.18. 20:30 | 17 |
| 2022.06.18. 20:45 | 17 |
| 2022.06.18. 21:00 | 17 |
| 2022.06.18. 21:15 | 17 |
| 2022.06.18. 21:30 | 17 |
| 2022.06.18. 21:45 | 17 |
| 2022.06.18. 22:00 | 17 |
| 2022.06.18. 22:15 | 17 |
| 2022.06.18. 22:30 | 17 |
| 2022.06.18. 22:45 | 17 |
| 2022.06.18. 23:00 | 17 |
| 2022.06.18. 23:15 | 17 |
| 2022.06.18. 23:30 | 17 |
| 2022.06.18. 23:45 | 17 |
| 2022.06.19. 00:00 | 17 |
| 2022.06.19. 00:15 | 17 |
| 2022.06.19. 00:30 | 17 |
| 2022.06.19. 00:45 | 17 |
| 2022.06.19. 01:00 | 17 |
| 2022.06.19. 01:15 | 17 |
| 2022.06.19. 01:30 | 17 |
| 2022.06.19. 01:45 | 17 |
| 2022.06.19. 02:00 | 17 |
| 2022.06.19. 02:15 | 17 |
| 2022.06.19. 02:30 | 17 |
| 2022.06.19. 02:45 | 17 |
| 2022.06.19. 03:00 | 17 |
| 2022.06.19. 03:15 | 17 |
| 2022.06.19. 03:30 | 17 |
| 2022.06.19. 03:45 | 17 |
| 2022.06.19. 04:00 | 17 |
| 2022.06.19. 04:15 | 17 |
| 2022.06.19. 04:30 | 17 |
| 2022.06.19. 04:45 | 17 |
| 2022.06.19. 05:00 | 17 |
| 2022.06.19. 05:15 | 17 |
| 2022.06.19. 05:30 | 17 |
| 2022.06.19. 05:45 | 17 |
| 2022.06.19. 06:00 | 17 |
| 2022.06.19. 06:15 | 17 |
| 2022.06.19. 06:30 | 17 |
| 2022.06.19. 06:45 | 17 |
| 2022.06.19. 07:00 | 17 |
| 2022.06.19. 07:15 | 17 |
| 2022.06.19. 07:30 | 17 |
| 2022.06.19. 07:45 | 17 |
| 2022.06.19. 08:00 | 17 |
| 2022.06.19. 08:15 | 17 |
| 2022.06.19. 08:30 | 17 |
| 2022.06.19. 08:45 | 17 |
| 2022.06.19. 09:00 | 17 |
| 2022.06.19. 09:15 | 17 |
| 2022.06.19. 09:30 | 17 |
| 2022.06.19. 09:45 | 17 |
| 2022.06.19. 10:00 | 17 |
| 2022.06.19. 10:15 | 17 |
| 2022.06.19. 10:30 | 17 |
| 2022.06.19. 10:45 | 17 |
| 2022.06.19. 11:00 | 17 |
| 2022.06.19. 11:15 | 17 |
| 2022.06.19. 11:30 | 17 |
| 2022.06.19. 11:45 | 17 |
| 2022.06.19. 12:00 | 17 |
| 2022.06.19. 12:15 | 17 |
| 2022.06.19. 12:30 | 17 |
| 2022.06.19. 12:45 | 17 |
| 2022.06.19. 13:00 | 17 |
| 2022.06.19. 13:15 | 17 |
| 2022.06.19. 13:30 | 17 |
| 2022.06.19. 13:45 | 17 |
| 2022.06.19. 14:00 | 17 |
| 2022.06.19. 14:15 | 17 |
| 2022.06.19. 14:30 | 17 |
| 2022.06.19. 14:45 | 17 |
| 2022.06.19. 15:00 | 17 |
| 2022.06.19. 15:15 | 17 |
| 2022.06.19. 15:30 | 17 |
| 2022.06.19. 15:45 | 17 |
| 2022.06.19. 16:00 | 17 |
| 2022.06.19. 16:15 | 17 |
| 2022.06.19. 16:30 | 17 |
| 2022.06.19. 16:45 | 17 |
| 2022.06.19. 17:00 | 17 |
| 2022.06.19. 17:15 | 17 |
| 2022.06.19. 17:30 | 17 |
| 2022.06.19. 17:45 | 17 |
| 2022.06.19. 18:00 | 17 |
| 2022.06.19. 18:15 | 17 |
| 2022.06.19. 18:30 | 17 |
| 2022.06.19. 18:45 | 17 |
| 2022.06.19. 19:00 | 17 |
| 2022.06.19. 19:15 | 17 |
| 2022.06.19. 19:30 | 17 |
| 2022.06.19. 19:45 | 17 |
| 2022.06.19. 20:00 | 17 |
| 2022.06.19. 20:15 | 17 |
| 2022.06.19. 20:30 | 17 |
| 2022.06.19. 20:45 | 17 |
| 2022.06.19. 21:00 | 17 |
| 2022.06.19. 21:15 | 17 |
| 2022.06.19. 21:30 | 17 |
| 2022.06.19. 21:45 | 17 |
| 2022.06.19. 22:00 | 17 |
| 2022.06.19. 22:15 | 17 |
| 2022.06.19. 22:30 | 17 |
| 2022.06.19. 22:45 | 17 |
| 2022.06.19. 23:00 | 17 |
| 2022.06.19. 23:15 | 17 |
| 2022.06.19. 23:30 | 17 |
| 2022.06.19. 23:45 | 17 |
| 2022.06.20. 00:00 | 17 |
| 2022.06.20. 00:15 | 17 |
| 2022.06.20. 00:30 | 17 |
| 2022.06.20. 00:45 | 17 |
| 2022.06.20. 01:00 | 17 |
| 2022.06.20. 01:15 | 17 |
| 2022.06.20. 01:30 | 17 |
| 2022.06.20. 01:45 | 17 |
| 2022.06.20. 02:00 | 17 |
| 2022.06.20. 02:15 | 17 |
| 2022.06.20. 02:30 | 17 |
| 2022.06.20. 02:45 | 17 |
| 2022.06.20. 03:00 | 17 |
| 2022.06.20. 03:15 | 17 |
| 2022.06.20. 03:30 | 17 |
| 2022.06.20. 03:45 | 17 |
| 2022.06.20. 04:00 | 17 |
| 2022.06.20. 04:15 | 17 |
| 2022.06.20. 04:30 | 17 |
| 2022.06.20. 04:45 | 17 |
| 2022.06.20. 05:00 | 17 |
| 2022.06.20. 05:15 | 17 |
| 2022.06.20. 05:30 | 17 |
| 2022.06.20. 05:45 | 17 |
| 2022.06.20. 06:00 | 17 |
| 2022.06.20. 06:15 | 17 |
| 2022.06.20. 06:30 | 17 |
| 2022.06.20. 06:45 | 17 |
| 2022.06.20. 07:00 | 17 |
| 2022.06.20. 07:15 | 17 |
| 2022.06.20. 07:30 | 17 |
| 2022.06.20. 07:45 | 17 |
| 2022.06.20. 08:00 | 17 |
| 2022.06.20. 08:15 | 17 |
| 2022.06.20. 08:30 | 17 |
| 2022.06.20. 08:45 | 17 |
| 2022.06.20. 09:00 | 17 |
| 2022.06.20. 09:15 | 17 |
| 2022.06.20. 09:30 | 17 |
| 2022.06.20. 09:45 | 17 |
| 2022.06.20. 10:00 | 17 |
| 2022.06.20. 10:15 | 17 |
| 2022.06.20. 10:30 | 17 |
| 2022.06.20. 10:45 | 17 |
| 2022.06.20. 11:00 | 17 |
| 2022.06.20. 11:15 | 17 |
| 2022.06.20. 11:30 | 17 |
| 2022.06.20. 11:45 | 17 |
| 2022.06.20. 12:00 | 17 |
| 2022.06.20. 12:15 | 17 |
| 2022.06.20. 12:30 | 17 |
| 2022.06.20. 12:45 | 17 |
| 2022.06.20. 13:00 | 17 |
| 2022.06.20. 13:15 | 17 |
| 2022.06.20. 13:30 | 17 |
| 2022.06.20. 13:45 | 17 |
| 2022.06.20. 14:00 | 17 |
| 2022.06.20. 14:15 | 17 |
| 2022.06.20. 14:30 | 17 |
| 2022.06.20. 14:45 | 17 |
| 2022.06.20. 15:00 | 17 |
| 2022.06.20. 15:15 | 17 |
| 2022.06.20. 15:30 | 17 |
| 2022.06.20. 15:45 | 17 |
| 2022.06.20. 16:00 | 17 |
| 2022.06.20. 16:15 | 17 |
| 2022.06.20. 16:30 | 17 |
| 2022.06.20. 16:45 | 17 |
| 2022.06.20. 17:00 | 17 |
| 2022.06.20. 17:15 | 17 |
| 2022.06.20. 17:30 | 17 |
| 2022.06.20. 17:45 | 17 |
| 2022.06.20. 18:00 | 17 |
| 2022.06.20. 18:15 | 17 |
| 2022.06.20. 18:30 | 17 |
| 2022.06.20. 18:45 | 17 |
| 2022.06.20. 19:00 | 17 |
| 2022.06.20. 19:15 | 17 |
| 2022.06.20. 19:30 | 17 |
| 2022.06.20. 19:45 | 17 |
| 2022.06.20. 20:00 | 17 |
| 2022.06.20. 20:15 | 17 |
| 2022.06.20. 20:30 | 17 |
| 2022.06.20. 20:45 | 17 |
| 2022.06.20. 21:00 | 17 |
| 2022.06.20. 21:15 | 17 |
| 2022.06.20. 21:30 | 17 |
| 2022.06.20. 21:45 | 17 |
| 2022.06.20. 22:00 | 17 |
| 2022.06.20. 22:15 | 17 |
| 2022.06.20. 22:30 | 17 |
| 2022.06.20. 22:45 | 17 |
| 2022.06.20. 23:00 | 17 |
| 2022.06.20. 23:15 | 17 |
| 2022.06.20. 23:30 | 17 |
| 2022.06.20. 23:45 | 17 |
| 2022.06.21. 00:00 | 17 |
| 2022.06.21. 00:15 | 17 |
| 2022.06.21. 00:30 | 17 |
| 2022.06.21. 00:45 | 17 |
| 2022.06.21. 01:00 | 17 |
| 2022.06.21. 01:15 | 17 |
| 2022.06.21. 01:30 | 17 |
| 2022.06.21. 01:45 | 17 |
| 2022.06.21. 02:00 | 17 |
| 2022.06.21. 02:15 | 17 |
| 2022.06.21. 02:30 | 17 |
| 2022.06.21. 02:45 | 17 |
| 2022.06.21. 03:00 | 17 |
| 2022.06.21. 03:15 | 17 |
| 2022.06.21. 03:30 | 17 |
| 2022.06.21. 03:45 | 17 |
| 2022.06.21. 04:00 | 17 |
| 2022.06.21. 04:15 | 17 |
| 2022.06.21. 04:30 | 17 |
| 2022.06.21. 04:45 | 17 |
| 2022.06.21. 05:00 | 17 |
| 2022.06.21. 05:15 | 17 |
| 2022.06.21. 05:30 | 17 |
| 2022.06.21. 05:45 | 17 |
| 2022.06.21. 06:00 | 17 |
| 2022.06.21. 06:15 | 17 |
| 2022.06.21. 06:30 | 17 |
| 2022.06.21. 06:45 | 17 |
| 2022.06.21. 07:00 | 17 |
| 2022.06.21. 07:15 | 17 |
| 2022.06.21. 07:30 | 17 |
| 2022.06.21. 07:45 | 17 |
| 2022.06.21. 08:00 | 17 |
| 2022.06.21. 08:15 | 17 |
| 2022.06.21. 08:30 | 17 |
| 2022.06.21. 08:45 | 17 |
| 2022.06.21. 09:00 | 17 |
| 2022.06.21. 09:15 | 17 |
| 2022.06.21. 09:30 | 17 |
| 2022.06.21. 09:45 | 17 |
| 2022.06.21. 10:00 | 17 |
| 2022.06.21. 10:15 | 17 |
| 2022.06.21. 10:30 | 17 |
| 2022.06.21. 10:45 | 17 |
| 2022.06.21. 11:00 | 17 |
| 2022.06.21. 11:15 | 17 |
| 2022.06.21. 11:30 | 17 |
| 2022.06.21. 11:45 | 17 |
| 2022.06.21. 12:00 | 17 |
| 2022.06.21. 12:15 | 17 |
| 2022.06.21. 12:30 | 17 |
| 2022.06.21. 12:45 | 17 |
| 2022.06.21. 13:00 | 17 |
| 2022.06.21. 13:15 | 17 |
| 2022.06.21. 13:30 | 17 |
| 2022.06.21. 13:45 | 17 |
| 2022.06.21. 14:00 | 17 |
| 2022.06.21. 14:15 | 17 |
| 2022.06.21. 14:30 | 17 |
| 2022.06.21. 14:45 | 17 |
| 2022.06.21. 15:00 | 17 |
| 2022.06.21. 15:15 | 17 |
| 2022.06.21. 15:30 | 17 |
| 2022.06.21. 15:45 | 17 |
| 2022.06.21. 16:00 | 17 |
| 2022.06.21. 16:15 | 17 |
| 2022.06.21. 16:30 | 17 |
| 2022.06.21. 16:45 | 17 |
| 2022.06.21. 17:00 | 17 |
| 2022.06.21. 17:15 | 17 |
| 2022.06.21. 17:30 | 17 |
| 2022.06.21. 17:45 | 17 |
| 2022.06.21. 18:00 | 17 |
| 2022.06.21. 18:15 | 17 |
| 2022.06.21. 18:30 | 17 |
| 2022.06.21. 18:45 | 17 |
| 2022.06.21. 19:00 | 17 |
| 2022.06.21. 19:15 | 17 |
| 2022.06.21. 19:30 | 17 |
| 2022.06.21. 19:45 | 17 |
| 2022.06.21. 20:00 | 17 |
| 2022.06.21. 20:15 | 17 |
| 2022.06.21. 20:30 | 17 |
| 2022.06.21. 20:45 | 17 |
| 2022.06.21. 21:00 | 17 |
| 2022.06.21. 21:15 | 17 |
| 2022.06.21. 21:30 | 17 |
| 2022.06.21. 21:45 | 17 |
| 2022.06.21. 22:00 | 17 |
| 2022.06.21. 22:15 | 17 |
| 2022.06.21. 22:30 | 17 |
| 2022.06.21. 22:45 | 17 |
| 2022.06.21. 23:00 | 17 |
| 2022.06.21. 23:15 | 17 |
| 2022.06.21. 23:30 | 17 |
| 2022.06.21. 23:45 | 17 |
| 2022.06.22. 00:00 | 17 |
| 2022.06.22. 00:15 | 17 |
| 2022.06.22. 00:30 | 17 |
| 2022.06.22. 00:45 | 17 |
| 2022.06.22. 01:00 | 17 |
| 2022.06.22. 01:15 | 17 |
| 2022.06.22. 01:30 | 17 |
| 2022.06.22. 01:45 | 17 |
| 2022.06.22. 02:00 | 17 |
| 2022.06.22. 02:15 | 17 |
| 2022.06.22. 02:30 | 17 |
| 2022.06.22. 02:45 | 17 |
| 2022.06.22. 03:00 | 17 |
| 2022.06.22. 03:15 | 17 |
| 2022.06.22. 03:30 | 17 |
| 2022.06.22. 03:45 | 17 |
| 2022.06.22. 04:00 | 17 |
| 2022.06.22. 04:15 | 17 |
| 2022.06.22. 04:30 | 17 |
| 2022.06.22. 04:45 | 17 |
| 2022.06.22. 05:00 | 17 |
| 2022.06.22. 05:15 | 17 |
| 2022.06.22. 05:30 | 17 |
| 2022.06.22. 05:45 | 17 |
| 2022.06.22. 06:00 | 17 |
| 2022.06.22. 06:15 | 17 |
| 2022.06.22. 06:30 | 17 |
| 2022.06.22. 06:45 | 17 |
| 2022.06.22. 07:00 | 17 |
| 2022.06.22. 07:15 | 17 |
| 2022.06.22. 07:30 | 17 |
| 2022.06.22. 07:45 | 17 |
| 2022.06.22. 08:00 | 17 |
| 2022.06.22. 08:15 | 17 |
| 2022.06.22. 08:30 | 17 |
| 2022.06.22. 08:45 | 17 |
| 2022.06.22. 09:00 | 17 |
| 2022.06.22. 09:15 | 17 |
| 2022.06.22. 09:30 | 17 |
| 2022.06.22. 09:45 | 17 |
| 2022.06.22. 10:00 | 17 |
| 2022.06.22. 10:15 | 17 |
| 2022.06.22. 10:30 | 17 |
| 2022.06.22. 10:45 | 17 |
| 2022.06.22. 11:00 | 17 |
| 2022.06.22. 11:15 | 17 |
| 2022.06.22. 11:30 | 17 |
| 2022.06.22. 11:45 | 17 |
| 2022.06.22. 12:00 | 17 |
| 2022.06.22. 12:15 | 17 |
| 2022.06.22. 12:30 | 17 |
| 2022.06.22. 12:45 | 17 |
| 2022.06.22. 13:00 | 17 |
| 2022.06.22. 13:15 | 17 |
| 2022.06.22. 13:30 | 17 |
| 2022.06.22. 13:45 | 17 |
| 2022.06.22. 14:00 | 17 |
| 2022.06.22. 14:15 | 17 |
| 2022.06.22. 14:30 | 17 |
| 2022.06.22. 14:45 | 17 |
| 2022.06.22. 15:00 | 17 |
| 2022.06.22. 15:15 | 17 |
| 2022.06.22. 15:30 | 17 |
| 2022.06.22. 15:45 | 17 |
| 2022.06.22. 16:00 | 17 |
| 2022.06.22. 16:15 | 17 |
| 2022.06.22. 16:30 | 17 |
| 2022.06.22. 16:45 | 17 |
| 2022.06.22. 17:00 | 17 |
| 2022.06.22. 17:15 | 17 |
| 2022.06.22. 17:30 | 17 |
| 2022.06.22. 17:45 | 17 |
| 2022.06.22. 18:00 | 17 |
| 2022.06.22. 18:15 | 17 |
| 2022.06.22. 18:30 | 17 |
| 2022.06.22. 18:45 | 17 |
| 2022.06.22. 19:00 | 17 |
| 2022.06.22. 19:15 | 17 |
| 2022.06.22. 19:30 | 17 |
| 2022.06.22. 19:45 | 17 |
| 2022.06.22. 20:00 | 17 |
| 2022.06.22. 20:15 | 17 |
| 2022.06.22. 20:30 | 17 |
| 2022.06.22. 20:45 | 17 |
| 2022.06.22. 21:00 | 17 |
| 2022.06.22. 21:15 | 17 |
| 2022.06.22. 21:30 | 17 |
| 2022.06.22. 21:45 | 17 |
| 2022.06.22. 22:00 | 17 |
| 2022.06.22. 22:15 | 17 |
| 2022.06.22. 22:30 | 17 |
| 2022.06.22. 22:45 | 17 |
| 2022.06.22. 23:00 | 17 |
| 2022.06.22. 23:15 | 17 |
| 2022.06.22. 23:30 | 17 |
| 2022.06.22. 23:45 | 17 |
| 2022.06.23. 00:00 | 17 |
| 2022.06.23. 00:15 | 17 |
| 2022.06.23. 00:30 | 17 |
| 2022.06.23. 00:45 | 17 |
| 2022.06.23. 01:00 | 17 |
| 2022.06.23. 01:15 | 17 |
| 2022.06.23. 01:30 | 17 |
| 2022.06.23. 01:45 | 17 |
| 2022.06.23. 02:00 | 17 |
| 2022.06.23. 02:15 | 17 |
| 2022.06.23. 02:30 | 17 |
| 2022.06.23. 02:45 | 17 |
| 2022.06.23. 03:00 | 17 |
| 2022.06.23. 03:15 | 17 |
| 2022.06.23. 03:30 | 17 |
| 2022.06.23. 03:45 | 17 |
| 2022.06.23. 04:00 | 17 |
| 2022.06.23. 04:15 | 17 |
| 2022.06.23. 04:30 | 17 |
| 2022.06.23. 04:45 | 17 |
| 2022.06.23. 05:00 | 17 |
| 2022.06.23. 05:15 | 17 |
| 2022.06.23. 05:30 | 17 |
| 2022.06.23. 05:45 | 17 |
| 2022.06.23. 06:00 | 17 |
| 2022.06.23. 06:15 | 17 |
| 2022.06.23. 06:30 | 17 |
| 2022.06.23. 06:45 | 17 |
| 2022.06.23. 07:00 | 17 |
| 2022.06.23. 07:15 | 17 |
| 2022.06.23. 07:30 | 17 |
| 2022.06.23. 07:45 | 17 |
| 2022.06.23. 08:00 | 17 |
| 2022.06.23. 08:15 | 17 |
| 2022.06.23. 08:30 | 17 |
| 2022.06.23. 08:45 | 17 |
| 2022.06.23. 09:00 | 17 |
| 2022.06.23. 09:15 | 17 |
| 2022.06.23. 09:30 | 17 |
| 2022.06.23. 09:45 | 17 |
| 2022.06.23. 10:00 | 17 |
| 2022.06.23. 10:15 | 17 |
| 2022.06.23. 10:30 | 17 |
| 2022.06.23. 10:45 | 17 |
| 2022.06.23. 11:00 | 17 |
| 2022.06.23. 11:15 | 17 |
| 2022.06.23. 11:30 | 17 |
| 2022.06.23. 11:45 | 17 |
| 2022.06.23. 12:00 | 17 |
| 2022.06.23. 12:15 | 17 |
| 2022.06.23. 12:30 | 17 |
| 2022.06.23. 12:45 | 17 |
| 2022.06.23. 13:00 | 17 |
| 2022.06.23. 13:15 | 17 |
| 2022.06.23. 13:30 | 17 |
| 2022.06.23. 13:45 | 17 |
| 2022.06.23. 14:00 | 17 |
| 2022.06.23. 14:15 | 17 |
| 2022.06.23. 14:30 | 17 |
| 2022.06.23. 14:45 | 17 |
| 2022.06.23. 15:00 | 17 |
| 2022.06.23. 15:15 | 17 |
| 2022.06.23. 15:30 | 17 |
| 2022.06.23. 15:45 | 17 |
| 2022.06.23. 16:00 | 17 |
| 2022.06.23. 16:15 | 17 |
| 2022.06.23. 16:30 | 17 |
| 2022.06.23. 16:45 | 17 |
| 2022.06.23. 17:00 | 17 |
| 2022.06.23. 17:15 | 17 |
| 2022.06.23. 17:30 | 17 |
| 2022.06.23. 17:45 | 17 |
| 2022.06.23. 18:00 | 17 |
| 2022.06.23. 18:15 | 17 |
| 2022.06.23. 18:30 | 17 |
| 2022.06.23. 18:45 | 17 |
| 2022.06.23. 19:00 | 17 |
| 2022.06.23. 19:15 | 17 |
| 2022.06.23. 19:30 | 17 |
| 2022.06.23. 19:45 | 17 |
| 2022.06.23. 20:00 | 17 |
| 2022.06.23. 20:15 | 17 |
| 2022.06.23. 20:30 | 17 |
| 2022.06.23. 20:45 | 17 |
| 2022.06.23. 21:00 | 17 |
| 2022.06.23. 21:15 | 17 |
| 2022.06.23. 21:30 | 17 |
| 2022.06.23. 21:45 | 17 |
| 2022.06.23. 22:00 | 17 |
| 2022.06.23. 22:15 | 17 |
| 2022.06.23. 22:30 | 17 |
| 2022.06.23. 22:45 | 17 |
| 2022.06.23. 23:00 | 17 |
| 2022.06.23. 23:15 | 17 |
| 2022.06.23. 23:30 | 17 |
| 2022.06.23. 23:45 | 17 |
| 2022.06.24. 00:00 | 17 |
| 2022.06.24. 00:15 | 17 |
| 2022.06.24. 00:30 | 17 |
| 2022.06.24. 00:45 | 17 |
| 2022.06.24. 01:00 | 17 |
| 2022.06.24. 01:15 | 17 |
| 2022.06.24. 01:30 | 17 |
| 2022.06.24. 01:45 | 17 |
| 2022.06.24. 02:00 | 17 |
| 2022.06.24. 02:15 | 17 |
| 2022.06.24. 02:30 | 17 |
| 2022.06.24. 02:45 | 17 |
| 2022.06.24. 03:00 | 17 |
| 2022.06.24. 03:15 | 17 |
| 2022.06.24. 03:30 | 17 |
| 2022.06.24. 03:45 | 17 |
| 2022.06.24. 04:00 | 17 |
| 2022.06.24. 04:15 | 17 |
| 2022.06.24. 04:30 | 17 |
| 2022.06.24. 04:45 | 17 |
| 2022.06.24. 05:00 | 17 |
| 2022.06.24. 05:15 | 17 |
| 2022.06.24. 05:30 | 17 |
| 2022.06.24. 05:45 | 17 |
| 2022.06.24. 06:00 | 17 |
| 2022.06.24. 06:15 | 17 |
| 2022.06.24. 06:30 | 17 |
| 2022.06.24. 06:45 | 17 |
| 2022.06.24. 07:00 | 17 |
| 2022.06.24. 07:15 | 17 |
| 2022.06.24. 07:30 | 17 |
| 2022.06.24. 07:45 | 17 |
| 2022.06.24. 08:00 | 17 |
| 2022.06.24. 08:15 | 17 |
| 2022.06.24. 08:30 | 17 |
| 2022.06.24. 08:45 | 17 |
| 2022.06.24. 09:00 | 17 |
| 2022.06.24. 09:15 | 17 |
| 2022.06.24. 09:30 | 17 |
| 2022.06.24. 09:45 | 17 |
| 2022.06.24. 10:00 | 17 |
| 2022.06.24. 10:15 | 17 |
| 2022.06.24. 10:30 | 17 |
| 2022.06.24. 10:45 | 17 |
| 2022.06.24. 11:00 | 17 |
| 2022.06.24. 11:15 | 17 |
| 2022.06.24. 11:30 | 17 |
| 2022.06.24. 11:45 | 17 |
| 2022.06.24. 12:00 | 17 |
| 2022.06.24. 12:15 | 17 |
| 2022.06.24. 12:30 | 17 |
| 2022.06.24. 12:45 | 17 |
| 2022.06.24. 13:00 | 17 |
| 2022.06.24. 13:15 | 17 |
| 2022.06.24. 13:30 | 17 |
| 2022.06.24. 13:45 | 17 |
| 2022.06.24. 14:00 | 17 |
| 2022.06.24. 14:15 | 17 |
| 2022.06.24. 14:30 | 17 |
| 2022.06.24. 14:45 | 17 |
| 2022.06.24. 15:00 | 17 |
| 2022.06.24. 15:15 | 17 |
| 2022.06.24. 15:30 | 17 |
| 2022.06.24. 15:45 | 17 |
| 2022.06.24. 16:00 | 17 |
| 2022.06.24. 16:15 | 17 |
| 2022.06.24. 16:30 | 17 |
| 2022.06.24. 16:45 | 17 |
| 2022.06.24. 17:00 | 17 |
| 2022.06.24. 17:15 | 17 |
| 2022.06.24. 17:30 | 17 |
| 2022.06.24. 17:45 | 17 |
| 2022.06.24. 18:00 | 17 |
| 2022.06.24. 18:15 | 17 |
| 2022.06.24. 18:30 | 17 |
| 2022.06.24. 18:45 | 17 |
| 2022.06.24. 19:00 | 17 |
| 2022.06.24. 19:15 | 17 |
| 2022.06.24. 19:30 | 17 |
| 2022.06.24. 19:45 | 17 |
| 2022.06.24. 20:00 | 17 |
| 2022.06.24. 20:15 | 17 |
| 2022.06.24. 20:30 | 17 |
| 2022.06.24. 20:45 | 17 |
| 2022.06.24. 21:00 | 17 |
| 2022.06.24. 21:15 | 17 |
| 2022.06.24. 21:30 | 17 |
| 2022.06.24. 21:45 | 17 |
| 2022.06.24. 22:00 | 17 |
| 2022.06.24. 22:15 | 17 |
| 2022.06.24. 22:30 | 17 |
| 2022.06.24. 22:45 | 17 |
| 2022.06.24. 23:00 | 17 |
| 2022.06.24. 23:15 | 17 |
| 2022.06.24. 23:30 | 17 |
| 2022.06.24. 23:45 | 17 |
| 2022.06.25. 00:00 | 17 |
| 2022.06.25. 00:15 | 17 |
| 2022.06.25. 00:30 | 17 |
| 2022.06.25. 00:45 | 17 |
| 2022.06.25. 01:00 | 17 |
| 2022.06.25. 01:15 | 17 |
| 2022.06.25. 01:30 | 17 |
| 2022.06.25. 01:45 | 17 |
| 2022.06.25. 02:00 | 17 |
| 2022.06.25. 02:15 | 17 |
| 2022.06.25. 02:30 | 17 |
| 2022.06.25. 02:45 | 17 |
| 2022.06.25. 03:00 | 17 |
| 2022.06.25. 03:15 | 17 |
| 2022.06.25. 03:30 | 17 |
| 2022.06.25. 03:45 | 17 |
| 2022.06.25. 04:00 | 17 |
| 2022.06.25. 04:15 | 17 |
| 2022.06.25. 04:30 | 17 |
| 2022.06.25. 04:45 | 17 |
| 2022.06.25. 05:00 | 17 |
| 2022.06.25. 05:15 | 17 |
| 2022.06.25. 05:30 | 17 |
| 2022.06.25. 05:45 | 17 |
| 2022.06.25. 06:00 | 17 |
| 2022.06.25. 06:15 | 17 |
| 2022.06.25. 06:30 | 17 |
| 2022.06.25. 06:45 | 17 |
| 2022.06.25. 07:00 | 17 |
| 2022.06.25. 07:15 | 17 |
| 2022.06.25. 07:30 | 17 |
| 2022.06.25. 07:45 | 17 |
| 2022.06.25. 08:00 | 17 |
| 2022.06.25. 08:15 | 17 |
| 2022.06.25. 08:30 | 17 |
| 2022.06.25. 08:45 | 17 |
| 2022.06.25. 09:00 | 17 |
| 2022.06.25. 09:15 | 17 |
| 2022.06.25. 09:30 | 17 |
| 2022.06.25. 09:45 | 17 |
| 2022.06.25. 10:00 | 17 |
| 2022.06.25. 10:15 | 17 |
| 2022.06.25. 10:30 | 17 |
| 2022.06.25. 10:45 | 17 |
| 2022.06.25. 11:00 | 17 |
| 2022.06.25. 11:15 | 17 |
| 2022.06.25. 11:30 | 17 |
| 2022.06.25. 11:45 | 17 |
| 2022.06.25. 12:00 | 17 |
| 2022.06.25. 12:15 | 17 |
| 2022.06.25. 12:30 | 17 |
| 2022.06.25. 12:45 | 17 |
| 2022.06.25. 13:00 | 17 |
| 2022.06.25. 13:15 | 17 |
| 2022.06.25. 13:30 | 17 |
| 2022.06.25. 13:45 | 17 |
| 2022.06.25. 14:00 | 17 |
| 2022.06.25. 14:15 | 17 |
| 2022.06.25. 14:30 | 17 |
| 2022.06.25. 14:45 | 17 |
| 2022.06.25. 15:00 | 17 |
| 2022.06.25. 15:15 | 17 |
| 2022.06.25. 15:30 | 17 |
| 2022.06.25. 15:45 | 17 |
| 2022.06.25. 16:00 | 17 |
| 2022.06.25. 16:15 | 17 |
| 2022.06.25. 16:30 | 17 |
| 2022.06.25. 16:45 | 17 |
| 2022.06.25. 17:00 | 17 |
| 2022.06.25. 17:15 | 17 |
| 2022.06.25. 17:30 | 17 |
| 2022.06.25. 17:45 | 17 |
| 2022.06.25. 18:00 | 17 |
| 2022.06.25. 18:15 | 17 |
| 2022.06.25. 18:30 | 17 |
| 2022.06.25. 18:45 | 17 |
| 2022.06.25. 19:00 | 17 |
| 2022.06.25. 19:15 | 17 |
| 2022.06.25. 19:30 | 17 |
| 2022.06.25. 19:45 | 17 |
| 2022.06.25. 20:00 | 17 |
| 2022.06.25. 20:15 | 17 |
| 2022.06.25. 20:30 | 17 |
| 2022.06.25. 20:45 | 17 |
| 2022.06.25. 21:00 | 17 |
| 2022.06.25. 21:15 | 17 |
| 2022.06.25. 21:30 | 17 |
| 2022.06.25. 21:45 | 17 |
| 2022.06.25. 22:00 | 17 |
| 2022.06.25. 22:15 | 17 |
| 2022.06.25. 22:30 | 17 |
| 2022.06.25. 22:45 | 17 |
| 2022.06.25. 23:00 | 17 |
| 2022.06.25. 23:15 | 17 |
| 2022.06.25. 23:30 | 17 |
| 2022.06.25. 23:45 | 17 |
| 2022.06.26. 00:00 | 17 |
| 2022.06.26. 00:15 | 17 |
| 2022.06.26. 00:30 | 17 |
| 2022.06.26. 00:45 | 17 |
| 2022.06.26. 01:00 | 17 |
| 2022.06.26. 01:15 | 17 |
| 2022.06.26. 01:30 | 17 |
| 2022.06.26. 01:45 | 17 |
| 2022.06.26. 02:00 | 17 |
| 2022.06.26. 02:15 | 17 |
| 2022.06.26. 02:30 | 17 |
| 2022.06.26. 02:45 | 17 |
| 2022.06.26. 03:00 | 17 |
| 2022.06.26. 03:15 | 17 |
| 2022.06.26. 03:30 | 17 |
| 2022.06.26. 03:45 | 17 |
| 2022.06.26. 04:00 | 17 |
| 2022.06.26. 04:15 | 17 |
| 2022.06.26. 04:30 | 17 |
| 2022.06.26. 04:45 | 17 |
| 2022.06.26. 05:00 | 17 |
| 2022.06.26. 05:15 | 17 |
| 2022.06.26. 05:30 | 17 |
| 2022.06.26. 05:45 | 17 |
| 2022.06.26. 06:00 | 17 |
| 2022.06.26. 06:15 | 17 |
| 2022.06.26. 06:30 | 17 |
| 2022.06.26. 06:45 | 17 |
| 2022.06.26. 07:00 | 17 |
| 2022.06.26. 07:15 | 17 |
| 2022.06.26. 07:30 | 17 |
| 2022.06.26. 07:45 | 17 |
| 2022.06.26. 08:00 | 17 |
| 2022.06.26. 08:15 | 17 |
| 2022.06.26. 08:30 | 17 |
| 2022.06.26. 08:45 | 17 |
| 2022.06.26. 09:00 | 17 |
| 2022.06.26. 09:15 | 17 |
| 2022.06.26. 09:30 | 17 |
| 2022.06.26. 09:45 | 17 |
| 2022.06.26. 10:00 | 17 |
| 2022.06.26. 10:15 | 17 |
| 2022.06.26. 10:30 | 17 |
| 2022.06.26. 10:45 | 17 |
| 2022.06.26. 11:00 | 17 |
| 2022.06.26. 11:15 | 17 |
| 2022.06.26. 11:30 | 17 |
| 2022.06.26. 11:45 | 17 |
| 2022.06.26. 12:00 | 17 |
| 2022.06.26. 12:15 | 17 |
| 2022.06.26. 12:30 | 17 |
| 2022.06.26. 12:45 | 17 |
| 2022.06.26. 13:00 | 17 |
| 2022.06.26. 13:15 | 17 |
| 2022.06.26. 13:30 | 17 |
| 2022.06.26. 13:45 | 17 |
| 2022.06.26. 14:00 | 17 |
| 2022.06.26. 14:15 | 17 |
| 2022.06.26. 14:30 | 17 |
| 2022.06.26. 14:45 | 17 |
| 2022.06.26. 15:00 | 17 |
| 2022.06.26. 15:15 | 17 |
| 2022.06.26. 15:30 | 17 |
| 2022.06.26. 15:45 | 17 |
| 2022.06.26. 16:00 | 17 |
| 2022.06.26. 16:15 | 17 |
| 2022.06.26. 16:30 | 17 |
| 2022.06.26. 16:45 | 17 |
| 2022.06.26. 17:00 | 17 |
| 2022.06.26. 17:15 | 17 |
| 2022.06.26. 17:30 | 17 |
| 2022.06.26. 17:45 | 17 |
| 2022.06.26. 18:00 | 17 |
| 2022.06.26. 18:15 | 17 |
| 2022.06.26. 18:30 | 17 |
| 2022.06.26. 18:45 | 17 |
| 2022.06.26. 19:00 | 17 |
| 2022.06.26. 19:15 | 17 |
| 2022.06.26. 19:30 | 17 |
| 2022.06.26. 19:45 | 17 |
| 2022.06.26. 20:00 | 17 |
| 2022.06.26. 20:15 | 17 |
| 2022.06.26. 20:30 | 17 |
| 2022.06.26. 20:45 | 17 |
| 2022.06.26. 21:00 | 17 |
| 2022.06.26. 21:15 | 17 |
| 2022.06.26. 21:30 | 17 |
| 2022.06.26. 21:45 | 17 |
| 2022.06.26. 22:00 | 17 |
| 2022.06.26. 22:15 | 17 |
| 2022.06.26. 22:30 | 17 |
| 2022.06.26. 22:45 | 17 |
| 2022.06.26. 23:00 | 17 |
| 2022.06.26. 23:15 | 17 |
| 2022.06.26. 23:30 | 17 |
| 2022.06.26. 23:45 | 17 |
| 2022.06.27. 00:00 | 17 |
| 2022.06.27. 00:15 | 17 |
| 2022.06.27. 00:30 | 17 |
| 2022.06.27. 00:45 | 17 |
| 2022.06.27. 01:00 | 17 |
| 2022.06.27. 01:15 | 17 |
| 2022.06.27. 01:30 | 17 |
| 2022.06.27. 01:45 | 17 |
| 2022.06.27. 02:00 | 17 |
| 2022.06.27. 02:15 | 17 |
| 2022.06.27. 02:30 | 17 |
| 2022.06.27. 02:45 | 17 |
| 2022.06.27. 03:00 | 17 |
| 2022.06.27. 03:15 | 17 |
| 2022.06.27. 03:30 | 17 |
| 2022.06.27. 03:45 | 17 |
| 2022.06.27. 04:00 | 17 |
| 2022.06.27. 04:15 | 17 |
| 2022.06.27. 04:30 | 17 |
| 2022.06.27. 04:45 | 17 |
| 2022.06.27. 05:00 | 17 |
| 2022.06.27. 05:15 | 17 |
| 2022.06.27. 05:30 | 17 |
| 2022.06.27. 05:45 | 17 |
| 2022.06.27. 06:00 | 17 |
| 2022.06.27. 06:15 | 17 |
| 2022.06.27. 06:30 | 17 |
| 2022.06.27. 06:45 | 17 |
| 2022.06.27. 07:00 | 17 |
| 2022.06.27. 07:15 | 17 |
| 2022.06.27. 07:30 | 17 |
| 2022.06.27. 07:45 | 17 |
| 2022.06.27. 08:00 | 17 |
| 2022.06.27. 08:15 | 17 |
| 2022.06.27. 08:30 | 17 |
| 2022.06.27. 08:45 | 17 |
| 2022.06.27. 09:00 | 17 |
| 2022.06.27. 09:15 | 17 |
| 2022.06.27. 09:30 | 17 |
| 2022.06.27. 09:45 | 17 |
| 2022.06.27. 10:00 | 17 |
| 2022.06.27. 10:15 | 17 |
| 2022.06.27. 10:30 | 17 |
| 2022.06.27. 10:45 | 17 |
| 2022.06.27. 11:00 | 17 |
| 2022.06.27. 11:15 | 17 |
| 2022.06.27. 11:30 | 17 |
| 2022.06.27. 11:45 | 17 |
| 2022.06.27. 12:00 | 17 |
| 2022.06.27. 12:15 | 17 |
| 2022.06.27. 12:30 | 17 |
| 2022.06.27. 12:45 | 17 |
| 2022.06.27. 13:00 | 17 |
| 2022.06.27. 13:15 | 17 |
| 2022.06.27. 13:30 | 17 |
| 2022.06.27. 13:45 | 17 |
| 2022.06.27. 14:00 | 17 |
| 2022.06.27. 14:15 | 17 |
| 2022.06.27. 14:30 | 17 |
| 2022.06.27. 14:45 | 17 |
| 2022.06.27. 15:00 | 17 |
| 2022.06.27. 15:15 | 17 |
| 2022.06.27. 15:30 | 17 |
| 2022.06.27. 15:45 | 17 |
| 2022.06.27. 16:00 | 17 |
| 2022.06.27. 16:15 | 17 |
| 2022.06.27. 16:30 | 17 |
| 2022.06.27. 16:45 | 17 |
| 2022.06.27. 17:00 | 17 |
| 2022.06.27. 17:15 | 17 |
| 2022.06.27. 17:30 | 17 |
| 2022.06.27. 17:45 | 17 |
| 2022.06.27. 18:00 | 17 |
| 2022.06.27. 18:15 | 17 |
| 2022.06.27. 18:30 | 17 |
| 2022.06.27. 18:45 | 17 |
| 2022.06.27. 19:00 | 17 |
| 2022.06.27. 19:15 | 17 |
| 2022.06.27. 19:30 | 17 |
| 2022.06.27. 19:45 | 17 |
| 2022.06.27. 20:00 | 17 |
| 2022.06.27. 20:15 | 17 |
| 2022.06.27. 20:30 | 17 |
| 2022.06.27. 20:45 | 17 |
| 2022.06.27. 21:00 | 17 |
| 2022.06.27. 21:15 | 17 |
| 2022.06.27. 21:30 | 17 |
| 2022.06.27. 21:45 | 17 |
| 2022.06.27. 22:00 | 17 |
| 2022.06.27. 22:15 | 17 |
| 2022.06.27. 22:30 | 17 |
| 2022.06.27. 22:45 | 17 |
| 2022.06.27. 23:00 | 17 |
| 2022.06.27. 23:15 | 17 |
| 2022.06.27. 23:30 | 17 |
| 2022.06.27. 23:45 | 17 |
| 2022.06.28. 00:00 | 17 |
| 2022.06.28. 00:15 | 17 |
| 2022.06.28. 00:30 | 17 |
| 2022.06.28. 00:45 | 17 |
| 2022.06.28. 01:00 | 17 |
| 2022.06.28. 01:15 | 17 |
| 2022.06.28. 01:30 | 17 |
| 2022.06.28. 01:45 | 17 |
| 2022.06.28. 02:00 | 17 |
| 2022.06.28. 02:15 | 17 |
| 2022.06.28. 02:30 | 17 |
| 2022.06.28. 02:45 | 17 |
| 2022.06.28. 03:00 | 17 |
| 2022.06.28. 03:15 | 17 |
| 2022.06.28. 03:30 | 17 |
| 2022.06.28. 03:45 | 17 |
| 2022.06.28. 04:00 | 17 |
| 2022.06.28. 04:15 | 17 |
| 2022.06.28. 04:30 | 17 |
| 2022.06.28. 04:45 | 17 |
| 2022.06.28. 05:00 | 17 |
| 2022.06.28. 05:15 | 17 |
| 2022.06.28. 05:30 | 17 |
| 2022.06.28. 05:45 | 17 |
| 2022.06.28. 06:00 | 17 |
| 2022.06.28. 06:15 | 17 |
| 2022.06.28. 06:30 | 17 |
| 2022.06.28. 06:45 | 17 |
| 2022.06.28. 07:00 | 17 |
| 2022.06.28. 07:15 | 17 |
| 2022.06.28. 07:30 | 17 |
| 2022.06.28. 07:45 | 17 |
| 2022.06.28. 08:00 | 17 |
| 2022.06.28. 08:15 | 17 |
| 2022.06.28. 08:30 | 17 |
| 2022.06.28. 08:45 | 17 |
| 2022.06.28. 09:00 | 17 |
| 2022.06.28. 09:15 | 17 |
| 2022.06.28. 09:30 | 17 |
| 2022.06.28. 09:45 | 17 |
| 2022.06.28. 10:00 | 17 |
| 2022.06.28. 10:15 | 17 |
| 2022.06.28. 10:30 | 17 |
| 2022.06.28. 10:45 | 17 |
| 2022.06.28. 11:00 | 17 |
| 2022.06.28. 11:15 | 17 |
| 2022.06.28. 11:30 | 17 |
| 2022.06.28. 11:45 | 17 |
| 2022.06.28. 12:00 | 17 |
| 2022.06.28. 12:15 | 17 |
| 2022.06.28. 12:30 | 17 |
| 2022.06.28. 12:45 | 17 |
| 2022.06.28. 13:00 | 17 |
| 2022.06.28. 13:15 | 17 |
| 2022.06.28. 13:30 | 17 |
| 2022.06.28. 13:45 | 17 |
| 2022.06.28. 14:00 | 17 |
| 2022.06.28. 14:15 | 17 |
| 2022.06.28. 14:30 | 17 |
| 2022.06.28. 14:45 | 17 |
| 2022.06.28. 15:00 | 17 |
| 2022.06.28. 15:15 | 17 |
| 2022.06.28. 15:30 | 17 |
| 2022.06.28. 15:45 | 17 |
| 2022.06.28. 16:00 | 17 |
| 2022.06.28. 16:15 | 17 |
| 2022.06.28. 16:30 | 17 |
| 2022.06.28. 16:45 | 17 |
| 2022.06.28. 17:00 | 17 |
| 2022.06.28. 17:15 | 17 |
| 2022.06.28. 17:30 | 17 |
| 2022.06.28. 17:45 | 17 |
| 2022.06.28. 18:00 | 17 |
| 2022.06.28. 18:15 | 17 |
| 2022.06.28. 18:30 | 17 |
| 2022.06.28. 18:45 | 17 |
| 2022.06.28. 19:00 | 17 |
| 2022.06.28. 19:15 | 17 |
| 2022.06.28. 19:30 | 17 |
| 2022.06.28. 19:45 | 17 |
| 2022.06.28. 20:00 | 17 |
| 2022.06.28. 20:15 | 17 |
| 2022.06.28. 20:30 | 17 |
| 2022.06.28. 20:45 | 17 |
| 2022.06.28. 21:00 | 17 |
| 2022.06.28. 21:15 | 17 |
| 2022.06.28. 21:30 | 17 |
| 2022.06.28. 21:45 | 17 |
| 2022.06.28. 22:00 | 17 |
| 2022.06.28. 22:15 | 17 |
| 2022.06.28. 22:30 | 17 |
| 2022.06.28. 22:45 | 17 |
| 2022.06.28. 23:00 | 17 |
| 2022.06.28. 23:15 | 17 |
| 2022.06.28. 23:30 | 17 |
| 2022.06.28. 23:45 | 17 |
| 2022.06.29. 00:00 | 17 |
| 2022.06.29. 00:15 | 17 |
| 2022.06.29. 00:30 | 17 |
| 2022.06.29. 00:45 | 17 |
| 2022.06.29. 01:00 | 17 |
| 2022.06.29. 01:15 | 17 |
| 2022.06.29. 01:30 | 17 |
| 2022.06.29. 01:45 | 17 |
| 2022.06.29. 02:00 | 17 |
| 2022.06.29. 02:15 | 17 |
| 2022.06.29. 02:30 | 17 |
| 2022.06.29. 02:45 | 17 |
| 2022.06.29. 03:00 | 17 |
| 2022.06.29. 03:15 | 17 |
| 2022.06.29. 03:30 | 17 |
| 2022.06.29. 03:45 | 17 |
| 2022.06.29. 04:00 | 17 |
| 2022.06.29. 04:15 | 17 |
| 2022.06.29. 04:30 | 17 |
| 2022.06.29. 04:45 | 17 |
| 2022.06.29. 05:00 | 17 |
| 2022.06.29. 05:15 | 17 |
| 2022.06.29. 05:30 | 17 |
| 2022.06.29. 05:45 | 17 |
| 2022.06.29. 06:00 | 17 |
| 2022.06.29. 06:15 | 17 |
| 2022.06.29. 06:30 | 17 |
| 2022.06.29. 06:45 | 17 |
| 2022.06.29. 07:00 | 17 |
| 2022.06.29. 07:15 | 17 |
| 2022.06.29. 07:30 | 17 |
| 2022.06.29. 07:45 | 17 |
| 2022.06.29. 08:00 | 17 |
| 2022.06.29. 08:15 | 17 |
| 2022.06.29. 08:30 | 17 |
| 2022.06.29. 08:45 | 17 |
| 2022.06.29. 09:00 | 17 |
| 2022.06.29. 09:15 | 17 |
| 2022.06.29. 09:30 | 17 |
| 2022.06.29. 09:45 | 17 |
| 2022.06.29. 10:00 | 17 |
| 2022.06.29. 10:15 | 17 |
| 2022.06.29. 10:30 | 17 |
| 2022.06.29. 10:45 | 17 |
| 2022.06.29. 11:00 | 17 |
| 2022.06.29. 11:15 | 17 |
| 2022.06.29. 11:30 | 17 |
| 2022.06.29. 11:45 | 17 |
| 2022.06.29. 12:00 | 17 |
| 2022.06.29. 12:15 | 17 |
| 2022.06.29. 12:30 | 17 |
| 2022.06.29. 12:45 | 17 |
| 2022.06.29. 13:00 | 17 |
| 2022.06.29. 13:15 | 17 |
| 2022.06.29. 13:30 | 17 |
| 2022.06.29. 13:45 | 17 |
| 2022.06.29. 14:00 | 17 |
| 2022.06.29. 14:15 | 17 |
| 2022.06.29. 14:30 | 17 |
| 2022.06.29. 14:45 | 17 |
| 2022.06.29. 15:00 | 17 |
| 2022.06.29. 15:15 | 17 |
| 2022.06.29. 15:30 | 17 |
| 2022.06.29. 15:45 | 17 |
| 2022.06.29. 16:00 | 17 |
| 2022.06.29. 16:15 | 17 |
| 2022.06.29. 16:30 | 17 |
| 2022.06.29. 16:45 | 17 |
| 2022.06.29. 17:00 | 17 |
| 2022.06.29. 17:15 | 17 |
| 2022.06.29. 17:30 | 17 |
| 2022.06.29. 17:45 | 17 |
| 2022.06.29. 18:00 | 17 |
| 2022.06.29. 18:15 | 17 |
| 2022.06.29. 18:30 | 17 |
| 2022.06.29. 18:45 | 17 |
| 2022.06.29. 19:00 | 17 |
| 2022.06.29. 19:15 | 17 |
| 2022.06.29. 19:30 | 17 |
| 2022.06.29. 19:45 | 17 |
| 2022.06.29. 20:00 | 17 |
| 2022.06.29. 20:15 | 17 |
| 2022.06.29. 20:30 | 17 |
| 2022.06.29. 20:45 | 17 |
| 2022.06.29. 21:00 | 17 |
| 2022.06.29. 21:15 | 17 |
| 2022.06.29. 21:30 | 17 |
| 2022.06.29. 21:45 | 17 |
| 2022.06.29. 22:00 | 17 |
| 2022.06.29. 22:15 | 17 |
| 2022.06.29. 22:30 | 17 |
| 2022.06.29. 22:45 | 17 |
| 2022.06.29. 23:00 | 17 |
| 2022.06.29. 23:15 | 17 |
| 2022.06.29. 23:30 | 17 |
| 2022.06.29. 23:45 | 17 |
| 2022.06.30. 00:00 | 17 |
| 2022.06.30. 00:15 | 17 |
| 2022.06.30. 00:30 | 17 |
| 2022.06.30. 00:45 | 17 |
| 2022.06.30. 01:00 | 17 |
| 2022.06.30. 01:15 | 17 |
| 2022.06.30. 01:30 | 17 |
| 2022.06.30. 01:45 | 17 |
| 2022.06.30. 02:00 | 17 |
| 2022.06.30. 02:15 | 17 |
| 2022.06.30. 02:30 | 17 |
| 2022.06.30. 02:45 | 17 |
| 2022.06.30. 03:00 | 17 |
| 2022.06.30. 03:15 | 17 |
| 2022.06.30. 03:30 | 17 |
| 2022.06.30. 03:45 | 17 |
| 2022.06.30. 04:00 | 17 |
| 2022.06.30. 04:15 | 17 |
| 2022.06.30. 04:30 | 17 |
| 2022.06.30. 04:45 | 17 |
| 2022.06.30. 05:00 | 17 |
| 2022.06.30. 05:15 | 17 |
| 2022.06.30. 05:30 | 17 |
| 2022.06.30. 05:45 | 17 |
| 2022.06.30. 06:00 | 17 |
| 2022.06.30. 06:15 | 17 |
| 2022.06.30. 06:30 | 17 |
| 2022.06.30. 06:45 | 17 |
| 2022.06.30. 07:00 | 17 |
| 2022.06.30. 07:15 | 17 |
| 2022.06.30. 07:30 | 17 |
| 2022.06.30. 07:45 | 17 |
| 2022.06.30. 08:00 | 17 |
| 2022.06.30. 08:15 | 17 |
| 2022.06.30. 08:30 | 17 |
| 2022.06.30. 08:45 | 17 |
| 2022.06.30. 09:00 | 17 |
| 2022.06.30. 09:15 | 17 |
| 2022.06.30. 09:30 | 17 |
| 2022.06.30. 09:45 | 17 |
| 2022.06.30. 10:00 | 17 |
| 2022.06.30. 10:15 | 17 |
| 2022.06.30. 10:30 | 17 |
| 2022.06.30. 10:45 | 17 |
| 2022.06.30. 11:00 | 17 |
| 2022.06.30. 11:15 | 17 |
| 2022.06.30. 11:30 | 17 |
| 2022.06.30. 11:45 | 17 |
| 2022.06.30. 12:00 | 17 |
| 2022.06.30. 12:15 | 17 |
| 2022.06.30. 12:30 | 17 |
| 2022.06.30. 12:45 | 17 |
| 2022.06.30. 13:00 | 17 |
| 2022.06.30. 13:15 | 17 |
| 2022.06.30. 13:30 | 17 |
| 2022.06.30. 13:45 | 17 |
| 2022.06.30. 14:00 | 17 |
| 2022.06.30. 14:15 | 17 |
| 2022.06.30. 14:30 | 17 |
| 2022.06.30. 14:45 | 17 |
| 2022.06.30. 15:00 | 17 |
| 2022.06.30. 15:15 | 17 |
| 2022.06.30. 15:30 | 17 |
| 2022.06.30. 15:45 | 17 |
| 2022.06.30. 16:00 | 17 |
| 2022.06.30. 16:15 | 17 |
| 2022.06.30. 16:30 | 17 |
| 2022.06.30. 16:45 | 17 |
| 2022.06.30. 17:00 | 17 |
| 2022.06.30. 17:15 | 17 |
| 2022.06.30. 17:30 | 17 |
| 2022.06.30. 17:45 | 17 |
| 2022.06.30. 18:00 | 17 |
| 2022.06.30. 18:15 | 17 |
| 2022.06.30. 18:30 | 17 |
| 2022.06.30. 18:45 | 17 |
| 2022.06.30. 19:00 | 17 |
| 2022.06.30. 19:15 | 17 |
| 2022.06.30. 19:30 | 17 |
| 2022.06.30. 19:45 | 17 |
| 2022.06.30. 20:00 | 17 |
| 2022.06.30. 20:15 | 17 |
| 2022.06.30. 20:30 | 17 |
| 2022.06.30. 20:45 | 17 |
| 2022.06.30. 21:00 | 17 |
| 2022.06.30. 21:15 | 17 |
| 2022.06.30. 21:30 | 17 |
| 2022.06.30. 21:45 | 17 |
| 2022.06.30. 22:00 | 17 |
| 2022.06.30. 22:15 | 17 |
| 2022.06.30. 22:30 | 17 |
| 2022.06.30. 22:45 | 17 |
| 2022.06.30. 23:00 | 17 |
| 2022.06.30. 23:15 | 17 |
| 2022.06.30. 23:30 | 17 |
| 2022.06.30. 23:45 | 17 |
| 2022.07.01. 00:00 | 17 |
| 2022.07.01. 00:15 | 17 |
| 2022.07.01. 00:30 | 17 |
| 2022.07.01. 00:45 | 17 |
| 2022.07.01. 01:00 | 17 |
| 2022.07.01. 01:15 | 17 |
| 2022.07.01. 01:30 | 17 |
| 2022.07.01. 01:45 | 17 |
| 2022.07.01. 02:00 | 17 |
| 2022.07.01. 02:15 | 17 |
| 2022.07.01. 02:30 | 17 |
| 2022.07.01. 02:45 | 17 |
| 2022.07.01. 03:00 | 17 |
| 2022.07.01. 03:15 | 17 |
| 2022.07.01. 03:30 | 17 |
| 2022.07.01. 03:45 | 17 |
| 2022.07.01. 04:00 | 17 |
| 2022.07.01. 04:15 | 17 |
| 2022.07.01. 04:30 | 17 |
| 2022.07.01. 04:45 | 17 |
| 2022.07.01. 05:00 | 17 |
| 2022.07.01. 05:15 | 17 |
| 2022.07.01. 05:30 | 17 |
| 2022.07.01. 05:45 | 17 |
| 2022.07.01. 06:00 | 17 |
| 2022.07.01. 06:15 | 17 |
| 2022.07.01. 06:30 | 17 |
| 2022.07.01. 06:45 | 17 |
| 2022.07.01. 07:00 | 17 |
| 2022.07.01. 07:15 | 17 |
| 2022.07.01. 07:30 | 17 |
| 2022.07.01. 07:45 | 17 |
| 2022.07.01. 08:00 | 17 |
| 2022.07.01. 08:15 | 17 |
| 2022.07.01. 08:30 | 17 |
| 2022.07.01. 08:45 | 17 |
| 2022.07.01. 09:00 | 17 |
| 2022.07.01. 09:15 | 17 |
| 2022.07.01. 09:30 | 17 |
| 2022.07.01. 09:45 | 17 |
| 2022.07.01. 10:00 | 17 |
| 2022.07.01. 10:15 | 17 |
| 2022.07.01. 10:30 | 17 |
| 2022.07.01. 10:45 | 17 |
| 2022.07.01. 11:00 | 17 |
| 2022.07.01. 11:15 | 17 |
| 2022.07.01. 11:30 | 17 |
| 2022.07.01. 11:45 | 17 |
| 2022.07.01. 12:00 | 17 |
| 2022.07.01. 12:15 | 17 |
| 2022.07.01. 12:30 | 17 |
| 2022.07.01. 12:45 | 17 |
| 2022.07.01. 13:00 | 17 |
| 2022.07.01. 13:15 | 17 |
| 2022.07.01. 13:30 | 17 |
| 2022.07.01. 13:45 | 17 |
| 2022.07.01. 14:00 | 17 |
| 2022.07.01. 14:15 | 17 |
| 2022.07.01. 14:30 | 17 |
| 2022.07.01. 14:45 | 17 |
| 2022.07.01. 15:00 | 17 |
| 2022.07.01. 15:15 | 17 |
| 2022.07.01. 15:30 | 17 |
| 2022.07.01. 15:45 | 17 |
| 2022.07.01. 16:00 | 17 |
| 2022.07.01. 16:15 | 17 |
| 2022.07.01. 16:30 | 17 |
| 2022.07.01. 16:45 | 17 |
| 2022.07.01. 17:00 | 17 |
| 2022.07.01. 17:15 | 17 |
| 2022.07.01. 17:30 | 17 |
| 2022.07.01. 17:45 | 17 |
| 2022.07.01. 18:00 | 17 |
| 2022.07.01. 18:15 | 17 |
| 2022.07.01. 18:30 | 17 |
| 2022.07.01. 18:45 | 17 |
| 2022.07.01. 19:00 | 17 |
| 2022.07.01. 19:15 | 17 |
| 2022.07.01. 19:30 | 17 |
| 2022.07.01. 19:45 | 17 |
| 2022.07.01. 20:00 | 17 |
| 2022.07.01. 20:15 | 17 |
| 2022.07.01. 20:30 | 17 |
| 2022.07.01. 20:45 | 17 |
| 2022.07.01. 21:00 | 17 |
| 2022.07.01. 21:15 | 17 |
| 2022.07.01. 21:30 | 17 |
| 2022.07.01. 21:45 | 17 |
| 2022.07.01. 22:00 | 17 |
| 2022.07.01. 22:15 | 17 |
| 2022.07.01. 22:30 | 17 |
| 2022.07.01. 22:45 | 17 |
| 2022.07.01. 23:00 | 17 |
| 2022.07.01. 23:15 | 17 |
| 2022.07.01. 23:30 | 17 |
| 2022.07.01. 23:45 | 17 |
| 2022.07.02. 00:00 | 17 |
| 2022.07.02. 00:15 | 17 |
| 2022.07.02. 00:30 | 17 |
| 2022.07.02. 00:45 | 17 |
| 2022.07.02. 01:00 | 17 |
| 2022.07.02. 01:15 | 17 |
| 2022.07.02. 01:30 | 17 |
| 2022.07.02. 01:45 | 17 |
| 2022.07.02. 02:00 | 17 |
| 2022.07.02. 02:15 | 17 |
| 2022.07.02. 02:30 | 17 |
| 2022.07.02. 02:45 | 17 |
| 2022.07.02. 03:00 | 17 |
| 2022.07.02. 03:15 | 17 |
| 2022.07.02. 03:30 | 17 |
| 2022.07.02. 03:45 | 17 |
| 2022.07.02. 04:00 | 17 |
| 2022.07.02. 04:15 | 17 |
| 2022.07.02. 04:30 | 17 |
| 2022.07.02. 04:45 | 17 |
| 2022.07.02. 05:00 | 17 |
| 2022.07.02. 05:15 | 17 |
| 2022.07.02. 05:30 | 17 |
| 2022.07.02. 05:45 | 17 |
| 2022.07.02. 06:00 | 17 |
| 2022.07.02. 06:15 | 17 |
| 2022.07.02. 06:30 | 17 |
| 2022.07.02. 06:45 | 17 |
| 2022.07.02. 07:00 | 17 |
| 2022.07.02. 07:15 | 17 |
| 2022.07.02. 07:30 | 17 |
| 2022.07.02. 07:45 | 17 |
| 2022.07.02. 08:00 | 17 |
| 2022.07.02. 08:15 | 17 |
| 2022.07.02. 08:30 | 17 |
| 2022.07.02. 08:45 | 17 |
| 2022.07.02. 09:00 | 17 |
| 2022.07.02. 09:15 | 17 |
| 2022.07.02. 09:30 | 17 |
| 2022.07.02. 09:45 | 17 |
| 2022.07.02. 10:00 | 17 |
| 2022.07.02. 10:15 | 17 |
| 2022.07.02. 10:30 | 17 |
| 2022.07.02. 10:45 | 17 |
| 2022.07.02. 11:00 | 17 |
| 2022.07.02. 11:15 | 17 |
| 2022.07.02. 11:30 | 17 |
| 2022.07.02. 11:45 | 17 |
| 2022.07.02. 12:00 | 17 |
| 2022.07.02. 12:15 | 17 |
| 2022.07.02. 12:30 | 17 |
| 2022.07.02. 12:45 | 17 |
| 2022.07.02. 13:00 | 17 |
| 2022.07.02. 13:15 | 17 |
| 2022.07.02. 13:30 | 17 |
| 2022.07.02. 13:45 | 17 |
| 2022.07.02. 14:00 | 17 |
| 2022.07.02. 14:15 | 17 |
| 2022.07.02. 14:30 | 17 |
| 2022.07.02. 14:45 | 17 |
| 2022.07.02. 15:00 | 17 |
| 2022.07.02. 15:15 | 17 |
| 2022.07.02. 15:30 | 17 |
| 2022.07.02. 15:45 | 17 |
| 2022.07.02. 16:00 | 17 |
| 2022.07.02. 16:15 | 17 |
| 2022.07.02. 16:30 | 17 |
| 2022.07.02. 16:45 | 17 |
| 2022.07.02. 17:00 | 17 |
| 2022.07.02. 17:15 | 17 |
| 2022.07.02. 17:30 | 17 |
| 2022.07.02. 17:45 | 17 |
| 2022.07.02. 18:00 | 17 |
| 2022.07.02. 18:15 | 17 |
| 2022.07.02. 18:30 | 17 |
| 2022.07.02. 18:45 | 17 |
| 2022.07.02. 19:00 | 17 |
| 2022.07.02. 19:15 | 17 |
| 2022.07.02. 19:30 | 17 |
| 2022.07.02. 19:45 | 17 |
| 2022.07.02. 20:00 | 17 |
| 2022.07.02. 20:15 | 17 |
| 2022.07.02. 20:30 | 17 |
| 2022.07.02. 20:45 | 17 |
| 2022.07.02. 21:00 | 17 |
| 2022.07.02. 21:15 | 17 |
| 2022.07.02. 21:30 | 17 |
| 2022.07.02. 21:45 | 17 |
| 2022.07.02. 22:00 | 17 |
| 2022.07.02. 22:15 | 17 |
| 2022.07.02. 22:30 | 17 |
| 2022.07.02. 22:45 | 17 |
| 2022.07.02. 23:00 | 17 |
| 2022.07.02. 23:15 | 17 |
| 2022.07.02. 23:30 | 17 |
| 2022.07.02. 23:45 | 17 |
| 2022.07.03. 00:00 | 17 |
| 2022.07.03. 00:15 | 17 |
| 2022.07.03. 00:30 | 17 |
| 2022.07.03. 00:45 | 17 |
| 2022.07.03. 01:00 | 17 |
| 2022.07.03. 01:15 | 17 |
| 2022.07.03. 01:30 | 17 |
| 2022.07.03. 01:45 | 17 |
| 2022.07.03. 02:00 | 17 |
| 2022.07.03. 02:15 | 17 |
| 2022.07.03. 02:30 | 17 |
| 2022.07.03. 02:45 | 17 |
| 2022.07.03. 03:00 | 17 |
| 2022.07.03. 03:15 | 17 |
| 2022.07.03. 03:30 | 17 |
| 2022.07.03. 03:45 | 17 |
| 2022.07.03. 04:00 | 17 |
| 2022.07.03. 04:15 | 17 |
| 2022.07.03. 04:30 | 17 |
| 2022.07.03. 04:45 | 17 |
| 2022.07.03. 05:00 | 17 |
| 2022.07.03. 05:15 | 17 |
| 2022.07.03. 05:30 | 17 |
| 2022.07.03. 05:45 | 17 |
| 2022.07.03. 06:00 | 17 |
| 2022.07.03. 06:15 | 17 |
| 2022.07.03. 06:30 | 17 |
| 2022.07.03. 06:45 | 17 |
| 2022.07.03. 07:00 | 17 |
| 2022.07.03. 07:15 | 17 |
| 2022.07.03. 07:30 | 17 |
| 2022.07.03. 07:45 | 17 |
| 2022.07.03. 08:00 | 17 |
| 2022.07.03. 08:15 | 17 |
| 2022.07.03. 08:30 | 17 |
| 2022.07.03. 08:45 | 17 |
| 2022.07.03. 09:00 | 17 |
| 2022.07.03. 09:15 | 17 |
| 2022.07.03. 09:30 | 17 |
| 2022.07.03. 09:45 | 17 |
| 2022.07.03. 10:00 | 17 |
| 2022.07.03. 10:15 | 17 |
| 2022.07.03. 10:30 | 17 |
| 2022.07.03. 10:45 | 17 |
| 2022.07.03. 11:00 | 17 |
| 2022.07.03. 11:15 | 17 |
| 2022.07.03. 11:30 | 17 |
| 2022.07.03. 11:45 | 17 |
| 2022.07.03. 12:00 | 17 |
| 2022.07.03. 12:15 | 17 |
| 2022.07.03. 12:30 | 17 |
| 2022.07.03. 12:45 | 17 |
| 2022.07.03. 13:00 | 17 |
| 2022.07.03. 13:15 | 17 |
| 2022.07.03. 13:30 | 17 |
| 2022.07.03. 13:45 | 17 |
| 2022.07.03. 14:00 | 17 |
| 2022.07.03. 14:15 | 17 |
| 2022.07.03. 14:30 | 17 |
| 2022.07.03. 14:45 | 17 |
| 2022.07.03. 15:00 | 17 |
| 2022.07.03. 15:15 | 17 |
| 2022.07.03. 15:30 | 17 |
| 2022.07.03. 15:45 | 17 |
| 2022.07.03. 16:00 | 17 |
| 2022.07.03. 16:15 | 17 |
| 2022.07.03. 16:30 | 17 |
| 2022.07.03. 16:45 | 17 |
| 2022.07.03. 17:00 | 17 |
| 2022.07.03. 17:15 | 17 |
| 2022.07.03. 17:30 | 17 |
| 2022.07.03. 17:45 | 17 |
| 2022.07.03. 18:00 | 17 |
| 2022.07.03. 18:15 | 17 |
| 2022.07.03. 18:30 | 17 |
| 2022.07.03. 18:45 | 17 |
| 2022.07.03. 19:00 | 17 |
| 2022.07.03. 19:15 | 17 |
| 2022.07.03. 19:30 | 17 |
| 2022.07.03. 19:45 | 17 |
| 2022.07.03. 20:00 | 17 |
| 2022.07.03. 20:15 | 17 |
| 2022.07.03. 20:30 | 17 |
| 2022.07.03. 20:45 | 17 |
| 2022.07.03. 21:00 | 17 |
| 2022.07.03. 21:15 | 17 |
| 2022.07.03. 21:30 | 17 |
| 2022.07.03. 21:45 | 17 |
| 2022.07.03. 22:00 | 17 |
| 2022.07.03. 22:15 | 17 |
| 2022.07.03. 22:30 | 17 |
| 2022.07.03. 22:45 | 17 |
| 2022.07.03. 23:00 | 17 |
| 2022.07.03. 23:15 | 17 |
| 2022.07.03. 23:30 | 17 |
| 2022.07.03. 23:45 | 17 |
| 2022.07.04. 00:00 | 17 |
| 2022.07.04. 00:15 | 17 |
| 2022.07.04. 00:30 | 17 |
| 2022.07.04. 00:45 | 17 |
| 2022.07.04. 01:00 | 17 |
| 2022.07.04. 01:15 | 17 |
| 2022.07.04. 01:30 | 17 |
| 2022.07.04. 01:45 | 17 |
| 2022.07.04. 02:00 | 17 |
| 2022.07.04. 02:15 | 17 |
| 2022.07.04. 02:30 | 17 |
| 2022.07.04. 02:45 | 17 |
| 2022.07.04. 03:00 | 17 |
| 2022.07.04. 03:15 | 17 |
| 2022.07.04. 03:30 | 17 |
| 2022.07.04. 03:45 | 17 |
| 2022.07.04. 04:00 | 17 |
| 2022.07.04. 04:15 | 17 |
| 2022.07.04. 04:30 | 17 |
| 2022.07.04. 04:45 | 17 |
| 2022.07.04. 05:00 | 17 |
| 2022.07.04. 05:15 | 17 |
| 2022.07.04. 05:30 | 17 |
| 2022.07.04. 05:45 | 17 |
| 2022.07.04. 06:00 | 17 |
| 2022.07.04. 06:15 | 17 |
| 2022.07.04. 06:30 | 17 |
| 2022.07.04. 06:45 | 17 |
| 2022.07.04. 07:00 | 17 |
| 2022.07.04. 07:15 | 17 |
| 2022.07.04. 07:30 | 17 |
| 2022.07.04. 07:45 | 17 |
| 2022.07.04. 08:00 | 17 |
| 2022.07.04. 08:15 | 17 |
| 2022.07.04. 08:30 | 17 |
| 2022.07.04. 08:45 | 17 |
| 2022.07.04. 09:00 | 17 |
| 2022.07.04. 09:15 | 17 |
| 2022.07.04. 09:30 | 17 |
| 2022.07.04. 09:45 | 17 |
| 2022.07.04. 10:00 | 17 |
| 2022.07.04. 10:15 | 17 |
| 2022.07.04. 10:30 | 17 |
| 2022.07.04. 10:45 | 17 |
| 2022.07.04. 11:00 | 17 |
| 2022.07.04. 11:15 | 17 |
| 2022.07.04. 11:30 | 17 |
| 2022.07.04. 11:45 | 17 |
| 2022.07.04. 12:00 | 17 |
| 2022.07.04. 12:15 | 17 |
| 2022.07.04. 12:30 | 17 |
| 2022.07.04. 12:45 | 17 |
| 2022.07.04. 13:00 | 17 |
| 2022.07.04. 13:15 | 17 |
| 2022.07.04. 13:30 | 17 |
| 2022.07.04. 13:45 | 17 |
| 2022.07.04. 14:00 | 17 |
| 2022.07.04. 14:15 | 17 |
| 2022.07.04. 14:30 | 17 |
| 2022.07.04. 14:45 | 17 |
| 2022.07.04. 15:00 | 17 |
| 2022.07.04. 15:15 | 17 |
| 2022.07.04. 15:30 | 17 |
| 2022.07.04. 15:45 | 17 |
| 2022.07.04. 16:00 | 17 |
| 2022.07.04. 16:15 | 17 |
| 2022.07.04. 16:30 | 17 |
| 2022.07.04. 16:45 | 17 |
| 2022.07.04. 17:00 | 17 |
| 2022.07.04. 17:15 | 17 |
| 2022.07.04. 17:30 | 17 |
| 2022.07.04. 17:45 | 17 |
| 2022.07.04. 18:00 | 17 |
| 2022.07.04. 18:15 | 17 |
| 2022.07.04. 18:30 | 17 |
| 2022.07.04. 18:45 | 17 |
| 2022.07.04. 19:00 | 17 |
| 2022.07.04. 19:15 | 17 |
| 2022.07.04. 19:30 | 17 |
| 2022.07.04. 19:45 | 17 |
| 2022.07.04. 20:00 | 17 |
| 2022.07.04. 20:15 | 17 |
| 2022.07.04. 20:30 | 17 |
| 2022.07.04. 20:45 | 17 |
| 2022.07.04. 21:00 | 17 |
| 2022.07.04. 21:15 | 17 |
| 2022.07.04. 21:30 | 17 |
| 2022.07.04. 21:45 | 17 |
| 2022.07.04. 22:00 | 17 |
| 2022.07.04. 22:15 | 17 |
| 2022.07.04. 22:30 | 17 |
| 2022.07.04. 22:45 | 17 |
| 2022.07.04. 23:00 | 17 |
| 2022.07.04. 23:15 | 17 |
| 2022.07.04. 23:30 | 17 |
| 2022.07.04. 23:45 | 17 |
| 2022.07.05. 00:00 | 17 |
| 2022.07.05. 00:15 | 17 |
| 2022.07.05. 00:30 | 17 |
| 2022.07.05. 00:45 | 17 |
| 2022.07.05. 01:00 | 17 |
| 2022.07.05. 01:15 | 17 |
| 2022.07.05. 01:30 | 17 |
| 2022.07.05. 01:45 | 17 |
| 2022.07.05. 02:00 | 17 |
| 2022.07.05. 02:15 | 17 |
| 2022.07.05. 02:30 | 17 |
| 2022.07.05. 02:45 | 17 |
| 2022.07.05. 03:00 | 17 |
| 2022.07.05. 03:15 | 17 |
| 2022.07.05. 03:30 | 17 |
| 2022.07.05. 03:45 | 17 |
| 2022.07.05. 04:00 | 17 |
| 2022.07.05. 04:15 | 17 |
| 2022.07.05. 04:30 | 17 |
| 2022.07.05. 04:45 | 17 |
| 2022.07.05. 05:00 | 17 |
| 2022.07.05. 05:15 | 17 |
| 2022.07.05. 05:30 | 17 |
| 2022.07.05. 05:45 | 17 |
| 2022.07.05. 06:00 | 17 |
| 2022.07.05. 06:15 | 17 |
| 2022.07.05. 06:30 | 17 |
| 2022.07.05. 06:45 | 17 |
| 2022.07.05. 07:00 | 17 |
| 2022.07.05. 07:15 | 17 |
| 2022.07.05. 07:30 | 17 |
| 2022.07.05. 07:45 | 17 |
| 2022.07.05. 08:00 | 17 |
| 2022.07.05. 08:15 | 17 |
| 2022.07.05. 08:30 | 17 |
| 2022.07.05. 08:45 | 17 |
| 2022.07.05. 09:00 | 17 |
| 2022.07.05. 09:15 | 17 |
| 2022.07.05. 09:30 | 17 |
| 2022.07.05. 09:45 | 17 |
| 2022.07.05. 10:00 | 17 |
| 2022.07.05. 10:15 | 17 |
| 2022.07.05. 10:30 | 17 |
| 2022.07.05. 10:45 | 17 |
| 2022.07.05. 11:00 | 17 |
| 2022.07.05. 11:15 | 17 |
| 2022.07.05. 11:30 | 17 |
| 2022.07.05. 11:45 | 17 |
| 2022.07.05. 12:00 | 17 |
| 2022.07.05. 12:15 | 17 |
| 2022.07.05. 12:30 | 17 |
| 2022.07.05. 12:45 | 17 |
| 2022.07.05. 13:00 | 17 |
| 2022.07.05. 13:15 | 17 |
| 2022.07.05. 13:30 | 17 |
| 2022.07.05. 13:45 | 17 |
| 2022.07.05. 14:00 | 17 |
| 2022.07.05. 14:15 | 17 |
| 2022.07.05. 14:30 | 17 |
| 2022.07.05. 14:45 | 17 |
| 2022.07.05. 15:00 | 17 |
| 2022.07.05. 15:15 | 17 |
| 2022.07.05. 15:30 | 17 |
| 2022.07.05. 15:45 | 17 |
| 2022.07.05. 16:00 | 17 |
| 2022.07.05. 16:15 | 17 |
| 2022.07.05. 16:30 | 17 |
| 2022.07.05. 16:45 | 17 |
| 2022.07.05. 17:00 | 17 |
| 2022.07.05. 17:15 | 17 |
| 2022.07.05. 17:30 | 17 |
| 2022.07.05. 17:45 | 17 |
| 2022.07.05. 18:00 | 17 |
| 2022.07.05. 18:15 | 17 |
| 2022.07.05. 18:30 | 17 |
| 2022.07.05. 18:45 | 17 |
| 2022.07.05. 19:00 | 17 |
| 2022.07.05. 19:15 | 17 |
| 2022.07.05. 19:30 | 17 |
| 2022.07.05. 19:45 | 17 |
| 2022.07.05. 20:00 | 17 |
| 2022.07.05. 20:15 | 17 |
| 2022.07.05. 20:30 | 17 |
| 2022.07.05. 20:45 | 17 |
| 2022.07.05. 21:00 | 17 |
| 2022.07.05. 21:15 | 17 |
| 2022.07.05. 21:30 | 17 |
| 2022.07.05. 21:45 | 17 |
| 2022.07.05. 22:00 | 17 |
| 2022.07.05. 22:15 | 17 |
| 2022.07.05. 22:30 | 17 |
| 2022.07.05. 22:45 | 17 |
| 2022.07.05. 23:00 | 17 |
| 2022.07.05. 23:15 | 17 |
| 2022.07.05. 23:30 | 17 |
| 2022.07.05. 23:45 | 17 |
| 2022.07.06. 00:00 | 17 |
| 2022.07.06. 00:15 | 17 |
| 2022.07.06. 00:30 | 17 |
| 2022.07.06. 00:45 | 17 |
| 2022.07.06. 01:00 | 17 |
| 2022.07.06. 01:15 | 17 |
| 2022.07.06. 01:30 | 17 |
| 2022.07.06. 01:45 | 17 |
| 2022.07.06. 02:00 | 17 |
| 2022.07.06. 02:15 | 17 |
| 2022.07.06. 02:30 | 17 |
| 2022.07.06. 02:45 | 17 |
| 2022.07.06. 03:00 | 17 |
| 2022.07.06. 03:15 | 17 |
| 2022.07.06. 03:30 | 17 |
| 2022.07.06. 03:45 | 17 |
| 2022.07.06. 04:00 | 17 |
| 2022.07.06. 04:15 | 17 |
| 2022.07.06. 04:30 | 17 |
| 2022.07.06. 04:45 | 17 |
| 2022.07.06. 05:00 | 17 |
| 2022.07.06. 05:15 | 17 |
| 2022.07.06. 05:30 | 17 |
| 2022.07.06. 05:45 | 17 |
| 2022.07.06. 06:00 | 17 |
| 2022.07.06. 06:15 | 17 |
| 2022.07.06. 06:30 | 17 |
| 2022.07.06. 06:45 | 17 |
| 2022.07.06. 07:00 | 17 |
| 2022.07.06. 07:15 | 17 |
| 2022.07.06. 07:30 | 17 |
| 2022.07.06. 07:45 | 17 |
| 2022.07.06. 08:00 | 17 |
| 2022.07.06. 08:15 | 17 |
| 2022.07.06. 08:30 | 17 |
| 2022.07.06. 08:45 | 17 |
| 2022.07.06. 09:00 | 17 |
| 2022.07.06. 09:15 | 17 |
| 2022.07.06. 09:30 | 17 |
| 2022.07.06. 09:45 | 17 |
| 2022.07.06. 10:00 | 17 |
| 2022.07.06. 10:15 | 17 |
| 2022.07.06. 10:30 | 17 |
| 2022.07.06. 10:45 | 17 |
| 2022.07.06. 11:00 | 17 |
| 2022.07.06. 11:15 | 17 |
| 2022.07.06. 11:30 | 17 |
| 2022.07.06. 11:45 | 17 |
| 2022.07.06. 12:00 | 17 |
| 2022.07.06. 12:15 | 17 |
| 2022.07.06. 12:30 | 17 |
| 2022.07.06. 12:45 | 17 |
| 2022.07.06. 13:00 | 17 |
| 2022.07.06. 13:15 | 17 |
| 2022.07.06. 13:30 | 17 |
| 2022.07.06. 13:45 | 17 |
| 2022.07.06. 14:00 | 17 |
| 2022.07.06. 14:15 | 17 |
| 2022.07.06. 14:30 | 17 |
| 2022.07.06. 14:45 | 17 |
| 2022.07.06. 15:00 | 17 |
| 2022.07.06. 15:15 | 17 |
| 2022.07.06. 15:30 | 17 |
| 2022.07.06. 15:45 | 17 |
| 2022.07.06. 16:00 | 17 |
| 2022.07.06. 16:15 | 17 |
| 2022.07.06. 16:30 | 17 |
| 2022.07.06. 16:45 | 17 |
| 2022.07.06. 17:00 | 17 |
| 2022.07.06. 17:15 | 17 |
| 2022.07.06. 17:30 | 17 |
| 2022.07.06. 17:45 | 17 |
| 2022.07.06. 18:00 | 17 |
| 2022.07.06. 18:15 | 17 |
| 2022.07.06. 18:30 | 17 |
| 2022.07.06. 18:45 | 17 |
| 2022.07.06. 19:00 | 17 |
| 2022.07.06. 19:15 | 17 |
| 2022.07.06. 19:30 | 17 |
| 2022.07.06. 19:45 | 17 |
| 2022.07.06. 20:00 | 17 |
| 2022.07.06. 20:15 | 17 |
| 2022.07.06. 20:30 | 17 |
| 2022.07.06. 20:45 | 17 |
| 2022.07.06. 21:00 | 17 |
| 2022.07.06. 21:15 | 17 |
| 2022.07.06. 21:30 | 17 |
| 2022.07.06. 21:45 | 17 |
| 2022.07.06. 22:00 | 17 |
| 2022.07.06. 22:15 | 17 |
| 2022.07.06. 22:30 | 17 |
| 2022.07.06. 22:45 | 17 |
| 2022.07.06. 23:00 | 17 |
| 2022.07.06. 23:15 | 17 |
| 2022.07.06. 23:30 | 17 |
| 2022.07.06. 23:45 | 17 |
| 2022.07.07. 00:00 | 17 |
| 2022.07.07. 00:15 | 17 |
| 2022.07.07. 00:30 | 17 |
| 2022.07.07. 00:45 | 17 |
| 2022.07.07. 01:00 | 17 |
| 2022.07.07. 01:15 | 17 |
| 2022.07.07. 01:30 | 17 |
| 2022.07.07. 01:45 | 17 |
| 2022.07.07. 02:00 | 17 |
| 2022.07.07. 02:15 | 17 |
| 2022.07.07. 02:30 | 17 |
| 2022.07.07. 02:45 | 17 |
| 2022.07.07. 03:00 | 17 |
| 2022.07.07. 03:15 | 17 |
| 2022.07.07. 03:30 | 17 |
| 2022.07.07. 03:45 | 17 |
| 2022.07.07. 04:00 | 17 |
| 2022.07.07. 04:15 | 17 |
| 2022.07.07. 04:30 | 17 |
| 2022.07.07. 04:45 | 17 |
| 2022.07.07. 05:00 | 17 |
| 2022.07.07. 05:15 | 17 |
| 2022.07.07. 05:30 | 17 |
| 2022.07.07. 05:45 | 17 |
| 2022.07.07. 06:00 | 17 |
| 2022.07.07. 06:15 | 17 |
| 2022.07.07. 06:30 | 17 |
| 2022.07.07. 06:45 | 17 |
| 2022.07.07. 07:00 | 17 |
| 2022.07.07. 07:15 | 17 |
| 2022.07.07. 07:30 | 17 |
| 2022.07.07. 07:45 | 17 |
| 2022.07.07. 08:00 | 17 |
| 2022.07.07. 08:15 | 17 |
| 2022.07.07. 08:30 | 17 |
| 2022.07.07. 08:45 | 17 |
| 2022.07.07. 09:00 | 17 |
| 2022.07.07. 09:15 | 17 |
| 2022.07.07. 09:30 | 17 |
| 2022.07.07. 09:45 | 17 |
| 2022.07.07. 10:00 | 17 |
| 2022.07.07. 10:15 | 17 |
| 2022.07.07. 10:30 | 17 |
| 2022.07.07. 10:45 | 17 |
| 2022.07.07. 11:00 | 17 |
| 2022.07.07. 11:15 | 17 |
| 2022.07.07. 11:30 | 17 |
| 2022.07.07. 11:45 | 17 |
| 2022.07.07. 12:00 | 17 |
| 2022.07.07. 12:15 | 17 |
| 2022.07.07. 12:30 | 17 |
| 2022.07.07. 12:45 | 17 |
| 2022.07.07. 13:00 | 17 |
| 2022.07.07. 13:15 | 17 |
| 2022.07.07. 13:30 | 17 |
| 2022.07.07. 13:45 | 17 |
| 2022.07.07. 14:00 | 17 |
| 2022.07.07. 14:15 | 17 |
| 2022.07.07. 14:30 | 17 |
| 2022.07.07. 14:45 | 17 |
| 2022.07.07. 15:00 | 17 |
| 2022.07.07. 15:15 | 17 |
| 2022.07.07. 15:30 | 17 |
| 2022.07.07. 15:45 | 17 |
| 2022.07.07. 16:00 | 17 |
| 2022.07.07. 16:15 | 17 |
| 2022.07.07. 16:30 | 17 |
| 2022.07.07. 16:45 | 17 |
| 2022.07.07. 17:00 | 17 |
| 2022.07.07. 17:15 | 17 |
| 2022.07.07. 17:30 | 17 |
| 2022.07.07. 17:45 | 17 |
| 2022.07.07. 18:00 | 17 |
| 2022.07.07. 18:15 | 17 |
| 2022.07.07. 18:30 | 17 |
| 2022.07.07. 18:45 | 17 |
| 2022.07.07. 19:00 | 17 |
| 2022.07.07. 19:15 | 17 |
| 2022.07.07. 19:30 | 17 |
| 2022.07.07. 19:45 | 17 |
| 2022.07.07. 20:00 | 17 |
| 2022.07.07. 20:15 | 17 |
| 2022.07.07. 20:30 | 17 |
| 2022.07.07. 20:45 | 17 |
| 2022.07.07. 21:00 | 17 |
| 2022.07.07. 21:15 | 17 |
| 2022.07.07. 21:30 | 17 |
| 2022.07.07. 21:45 | 17 |
| 2022.07.07. 22:00 | 17 |
| 2022.07.07. 22:15 | 17 |
| 2022.07.07. 22:30 | 17 |
| 2022.07.07. 22:45 | 17 |
| 2022.07.07. 23:00 | 17 |
| 2022.07.07. 23:15 | 17 |
| 2022.07.07. 23:30 | 17 |
| 2022.07.07. 23:45 | 17 |
| 2022.07.08. 00:00 | 17 |
| 2022.07.08. 00:15 | 17 |
| 2022.07.08. 00:30 | 17 |
| 2022.07.08. 00:45 | 17 |
| 2022.07.08. 01:00 | 17 |
| 2022.07.08. 01:15 | 17 |
| 2022.07.08. 01:30 | 17 |
| 2022.07.08. 01:45 | 17 |
| 2022.07.08. 02:00 | 17 |
| 2022.07.08. 02:15 | 17 |
| 2022.07.08. 02:30 | 17 |
| 2022.07.08. 02:45 | 17 |
| 2022.07.08. 03:00 | 17 |
| 2022.07.08. 03:15 | 17 |
| 2022.07.08. 03:30 | 17 |
| 2022.07.08. 03:45 | 17 |
| 2022.07.08. 04:00 | 17 |
| 2022.07.08. 04:15 | 17 |
| 2022.07.08. 04:30 | 17 |
| 2022.07.08. 04:45 | 17 |
| 2022.07.08. 05:00 | 17 |
| 2022.07.08. 05:15 | 17 |
| 2022.07.08. 05:30 | 17 |
| 2022.07.08. 05:45 | 17 |
| 2022.07.08. 06:00 | 17 |
| 2022.07.08. 06:15 | 17 |
| 2022.07.08. 06:30 | 17 |
| 2022.07.08. 06:45 | 17 |
| 2022.07.08. 07:00 | 17 |
| 2022.07.08. 07:15 | 17 |
| 2022.07.08. 07:30 | 17 |
| 2022.07.08. 07:45 | 17 |
| 2022.07.08. 08:00 | 17 |
| 2022.07.08. 08:15 | 17 |
| 2022.07.08. 08:30 | 17 |
| 2022.07.08. 08:45 | 17 |
| 2022.07.08. 09:00 | 17 |
| 2022.07.08. 09:15 | 17 |
| 2022.07.08. 09:30 | 17 |
| 2022.07.08. 09:45 | 17 |
| 2022.07.08. 10:00 | 17 |
| 2022.07.08. 10:15 | 17 |
| 2022.07.08. 10:30 | 17 |
| 2022.07.08. 10:45 | 17 |
| 2022.07.08. 11:00 | 17 |
| 2022.07.08. 11:15 | 17 |
| 2022.07.08. 11:30 | 17 |
| 2022.07.08. 11:45 | 17 |
| 2022.07.08. 12:00 | 17 |
| 2022.07.08. 12:15 | 17 |
| 2022.07.08. 12:30 | 17 |
| 2022.07.08. 12:45 | 17 |
| 2022.07.08. 13:00 | 17 |
| 2022.07.08. 13:15 | 17 |
| 2022.07.08. 13:30 | 17 |
| 2022.07.08. 13:45 | 17 |
| 2022.07.08. 14:00 | 17 |
| 2022.07.08. 14:15 | 17 |
| 2022.07.08. 14:30 | 17 |
| 2022.07.08. 14:45 | 17 |
| 2022.07.08. 15:00 | 17 |
| 2022.07.08. 15:15 | 17 |
| 2022.07.08. 15:30 | 17 |
| 2022.07.08. 15:45 | 17 |
| 2022.07.08. 16:00 | 17 |
| 2022.07.08. 16:15 | 17 |
| 2022.07.08. 16:30 | 17 |
| 2022.07.08. 16:45 | 17 |
| 2022.07.08. 17:00 | 17 |
| 2022.07.08. 17:15 | 17 |
| 2022.07.08. 17:30 | 17 |
| 2022.07.08. 17:45 | 17 |
| 2022.07.08. 18:00 | 17 |
| 2022.07.08. 18:15 | 17 |
| 2022.07.08. 18:30 | 17 |
| 2022.07.08. 18:45 | 17 |
| 2022.07.08. 19:00 | 17 |
| 2022.07.08. 19:15 | 17 |
| 2022.07.08. 19:30 | 17 |
| 2022.07.08. 19:45 | 17 |
| 2022.07.08. 20:00 | 17 |
| 2022.07.08. 20:15 | 17 |
| 2022.07.08. 20:30 | 17 |
| 2022.07.08. 20:45 | 17 |
| 2022.07.08. 21:00 | 17 |
| 2022.07.08. 21:15 | 17 |
| 2022.07.08. 21:30 | 17 |
| 2022.07.08. 21:45 | 17 |
| 2022.07.08. 22:00 | 17 |
| 2022.07.08. 22:15 | 17 |
| 2022.07.08. 22:30 | 17 |
| 2022.07.08. 22:45 | 17 |
| 2022.07.08. 23:00 | 17 |
| 2022.07.08. 23:15 | 17 |
| 2022.07.08. 23:30 | 17 |
| 2022.07.08. 23:45 | 17 |
| 2022.07.09. 00:00 | 17 |
| 2022.07.09. 00:15 | 17 |
| 2022.07.09. 00:30 | 17 |
| 2022.07.09. 00:45 | 17 |
| 2022.07.09. 01:00 | 17 |
| 2022.07.09. 01:15 | 17 |
| 2022.07.09. 01:30 | 17 |
| 2022.07.09. 01:45 | 17 |
| 2022.07.09. 02:00 | 17 |
| 2022.07.09. 02:15 | 17 |
| 2022.07.09. 02:30 | 17 |
| 2022.07.09. 02:45 | 17 |
| 2022.07.09. 03:00 | 17 |
| 2022.07.09. 03:15 | 17 |
| 2022.07.09. 03:30 | 17 |
| 2022.07.09. 03:45 | 17 |
| 2022.07.09. 04:00 | 17 |
| 2022.07.09. 04:15 | 17 |
| 2022.07.09. 04:30 | 17 |
| 2022.07.09. 04:45 | 17 |
| 2022.07.09. 05:00 | 17 |
| 2022.07.09. 05:15 | 17 |
| 2022.07.09. 05:30 | 17 |
| 2022.07.09. 05:45 | 17 |
| 2022.07.09. 06:00 | 17 |
| 2022.07.09. 06:15 | 17 |
| 2022.07.09. 06:30 | 17 |
| 2022.07.09. 06:45 | 17 |
| 2022.07.09. 07:00 | 17 |
| 2022.07.09. 07:15 | 17 |
| 2022.07.09. 07:30 | 17 |
| 2022.07.09. 07:45 | 17 |
| 2022.07.09. 08:00 | 17 |
| 2022.07.09. 08:15 | 17 |
| 2022.07.09. 08:30 | 17 |
| 2022.07.09. 08:45 | 17 |
| 2022.07.09. 09:00 | 17 |
| 2022.07.09. 09:15 | 17 |
| 2022.07.09. 09:30 | 17 |
| 2022.07.09. 09:45 | 17 |
| 2022.07.09. 10:00 | 17 |
| 2022.07.09. 10:15 | 17 |
| 2022.07.09. 10:30 | 17 |
| 2022.07.09. 10:45 | 17 |
| 2022.07.09. 11:00 | 17 |
| 2022.07.09. 11:15 | 17 |
| 2022.07.09. 11:30 | 17 |
| 2022.07.09. 11:45 | 17 |
| 2022.07.09. 12:00 | 17 |
| 2022.07.09. 12:15 | 17 |
| 2022.07.09. 12:30 | 17 |
| 2022.07.09. 12:45 | 17 |
| 2022.07.09. 13:00 | 17 |
| 2022.07.09. 13:15 | 17 |
| 2022.07.09. 13:30 | 17 |
| 2022.07.09. 13:45 | 17 |
| 2022.07.09. 14:00 | 17 |
| 2022.07.09. 14:15 | 17 |
| 2022.07.09. 14:30 | 17 |
| 2022.07.09. 14:45 | 17 |
| 2022.07.09. 15:00 | 17 |
| 2022.07.09. 15:15 | 17 |
| 2022.07.09. 15:30 | 17 |
| 2022.07.09. 15:45 | 17 |
| 2022.07.09. 16:00 | 17 |
| 2022.07.09. 16:15 | 17 |
| 2022.07.09. 16:30 | 17 |
| 2022.07.09. 16:45 | 17 |
| 2022.07.09. 17:00 | 17 |
| 2022.07.09. 17:15 | 17 |
| 2022.07.09. 17:30 | 17 |
| 2022.07.09. 17:45 | 17 |
| 2022.07.09. 18:00 | 17 |
| 2022.07.09. 18:15 | 17 |
| 2022.07.09. 18:30 | 17 |
| 2022.07.09. 18:45 | 17 |
| 2022.07.09. 19:00 | 17 |
| 2022.07.09. 19:15 | 17 |
| 2022.07.09. 19:30 | 17 |
| 2022.07.09. 19:45 | 17 |
| 2022.07.09. 20:00 | 17 |
| 2022.07.09. 20:15 | 17 |
| 2022.07.09. 20:30 | 17 |
| 2022.07.09. 20:45 | 17 |
| 2022.07.09. 21:00 | 17 |
| 2022.07.09. 21:15 | 17 |
| 2022.07.09. 21:30 | 17 |
| 2022.07.09. 21:45 | 17 |
| 2022.07.09. 22:00 | 17 |
| 2022.07.09. 22:15 | 17 |
| 2022.07.09. 22:30 | 17 |
| 2022.07.09. 22:45 | 17 |
| 2022.07.09. 23:00 | 17 |
| 2022.07.09. 23:15 | 17 |
| 2022.07.09. 23:30 | 17 |
| 2022.07.09. 23:45 | 17 |
| 2022.07.10. 00:00 | 17 |
| 2022.07.10. 00:15 | 17 |
| 2022.07.10. 00:30 | 17 |
| 2022.07.10. 00:45 | 17 |
| 2022.07.10. 01:00 | 17 |
| 2022.07.10. 01:15 | 17 |
| 2022.07.10. 01:30 | 17 |
| 2022.07.10. 01:45 | 17 |
| 2022.07.10. 02:00 | 17 |
| 2022.07.10. 02:15 | 17 |
| 2022.07.10. 02:30 | 17 |
| 2022.07.10. 02:45 | 17 |
| 2022.07.10. 03:00 | 17 |
| 2022.07.10. 03:15 | 17 |
| 2022.07.10. 03:30 | 17 |
| 2022.07.10. 03:45 | 17 |
| 2022.07.10. 04:00 | 17 |
| 2022.07.10. 04:15 | 17 |
| 2022.07.10. 04:30 | 17 |
| 2022.07.10. 04:45 | 17 |
| 2022.07.10. 05:00 | 17 |
| 2022.07.10. 05:15 | 17 |
| 2022.07.10. 05:30 | 17 |
| 2022.07.10. 05:45 | 17 |
| 2022.07.10. 06:00 | 17 |
| 2022.07.10. 06:15 | 17 |
| 2022.07.10. 06:30 | 17 |
| 2022.07.10. 06:45 | 17 |
| 2022.07.10. 07:00 | 17 |
| 2022.07.10. 07:15 | 17 |
| 2022.07.10. 07:30 | 17 |
| 2022.07.10. 07:45 | 17 |
| 2022.07.10. 08:00 | 17 |
| 2022.07.10. 08:15 | 17 |
| 2022.07.10. 08:30 | 17 |
| 2022.07.10. 08:45 | 17 |
| 2022.07.10. 09:00 | 17 |
| 2022.07.10. 09:15 | 17 |
| 2022.07.10. 09:30 | 17 |
| 2022.07.10. 09:45 | 17 |
| 2022.07.10. 10:00 | 17 |
| 2022.07.10. 10:15 | 17 |
| 2022.07.10. 10:30 | 17 |
| 2022.07.10. 10:45 | 17 |
| 2022.07.10. 11:00 | 17 |
| 2022.07.10. 11:15 | 17 |
| 2022.07.10. 11:30 | 17 |
| 2022.07.10. 11:45 | 17 |
| 2022.07.10. 12:00 | 17 |
| 2022.07.10. 12:15 | 17 |
| 2022.07.10. 12:30 | 17 |
| 2022.07.10. 12:45 | 17 |
| 2022.07.10. 13:00 | 17 |
| 2022.07.10. 13:15 | 17 |
| 2022.07.10. 13:30 | 17 |
| 2022.07.10. 13:45 | 17 |
| 2022.07.10. 14:00 | 17 |
| 2022.07.10. 14:15 | 17 |
| 2022.07.10. 14:30 | 17 |
| 2022.07.10. 14:45 | 17 |
| 2022.07.10. 15:00 | 17 |
| 2022.07.10. 15:15 | 17 |
| 2022.07.10. 15:30 | 17 |
| 2022.07.10. 15:45 | 17 |
| 2022.07.10. 16:00 | 17 |
| 2022.07.10. 16:15 | 17 |
| 2022.07.10. 16:30 | 17 |
| 2022.07.10. 16:45 | 17 |
| 2022.07.10. 17:00 | 17 |
| 2022.07.10. 17:15 | 17 |
| 2022.07.10. 17:30 | 17 |
| 2022.07.10. 17:45 | 17 |
| 2022.07.10. 18:00 | 17 |
| 2022.07.10. 18:15 | 17 |
| 2022.07.10. 18:30 | 17 |
| 2022.07.10. 18:45 | 17 |
| 2022.07.10. 19:00 | 17 |
| 2022.07.10. 19:15 | 17 |
| 2022.07.10. 19:30 | 17 |
| 2022.07.10. 19:45 | 17 |
| 2022.07.10. 20:00 | 17 |
| 2022.07.10. 20:15 | 17 |
| 2022.07.10. 20:30 | 17 |
| 2022.07.10. 20:45 | 17 |
| 2022.07.10. 21:00 | 17 |
| 2022.07.10. 21:15 | 17 |
| 2022.07.10. 21:30 | 17 |
| 2022.07.10. 21:45 | 17 |
| 2022.07.10. 22:00 | 17 |
| 2022.07.10. 22:15 | 17 |
| 2022.07.10. 22:30 | 17 |
| 2022.07.10. 22:45 | 17 |
| 2022.07.10. 23:00 | 17 |
| 2022.07.10. 23:15 | 17 |
| 2022.07.10. 23:30 | 17 |
| 2022.07.10. 23:45 | 17 |
| 2022.07.11. 00:00 | 17 |
| 2022.07.11. 00:15 | 17 |
| 2022.07.11. 00:30 | 17 |
| 2022.07.11. 00:45 | 17 |
| 2022.07.11. 01:00 | 17 |
| 2022.07.11. 01:15 | 17 |
| 2022.07.11. 01:30 | 17 |
| 2022.07.11. 01:45 | 17 |
| 2022.07.11. 02:00 | 17 |
| 2022.07.11. 02:15 | 17 |
| 2022.07.11. 02:30 | 17 |
| 2022.07.11. 02:45 | 17 |
| 2022.07.11. 03:00 | 17 |
| 2022.07.11. 03:15 | 17 |
| 2022.07.11. 03:30 | 17 |
| 2022.07.11. 03:45 | 17 |
| 2022.07.11. 04:00 | 17 |
| 2022.07.11. 04:15 | 17 |
| 2022.07.11. 04:30 | 17 |
| 2022.07.11. 04:45 | 17 |
| 2022.07.11. 05:00 | 17 |
| 2022.07.11. 05:15 | 17 |
| 2022.07.11. 05:30 | 17 |
| 2022.07.11. 05:45 | 17 |
| 2022.07.11. 06:00 | 17 |
| 2022.07.11. 06:15 | 17 |
| 2022.07.11. 06:30 | 17 |
| 2022.07.11. 06:45 | 17 |
| 2022.07.11. 07:00 | 17 |
| 2022.07.11. 07:15 | 17 |
| 2022.07.11. 07:30 | 17 |
| 2022.07.11. 07:45 | 17 |
| 2022.07.11. 08:00 | 17 |
| 2022.07.11. 08:15 | 17 |
| 2022.07.11. 08:30 | 17 |
| 2022.07.11. 08:45 | 17 |
| 2022.07.11. 09:00 | 17 |
| 2022.07.11. 09:15 | 17 |
| 2022.07.11. 09:30 | 17 |
| 2022.07.11. 09:45 | 17 |
| 2022.07.11. 10:00 | 17 |
| 2022.07.11. 10:15 | 17 |
| 2022.07.11. 10:30 | 17 |
| 2022.07.11. 10:45 | 17 |
| 2022.07.11. 11:00 | 17 |
| 2022.07.11. 11:15 | 17 |
| 2022.07.11. 11:30 | 17 |
| 2022.07.11. 11:45 | 17 |
| 2022.07.11. 12:00 | 17 |
| 2022.07.11. 12:15 | 17 |
| 2022.07.11. 12:30 | 17 |
| 2022.07.11. 12:45 | 17 |
| 2022.07.11. 13:00 | 17 |
| 2022.07.11. 13:15 | 17 |
| 2022.07.11. 13:30 | 17 |
| 2022.07.11. 13:45 | 17 |
| 2022.07.11. 14:00 | 17 |
| 2022.07.11. 14:15 | 17 |
| 2022.07.11. 14:30 | 17 |
| 2022.07.11. 14:45 | 17 |
| 2022.07.11. 15:00 | 17 |
| 2022.07.11. 15:15 | 17 |
| 2022.07.11. 15:30 | 17 |
| 2022.07.11. 15:45 | 17 |
| 2022.07.11. 16:00 | 17 |
| 2022.07.11. 16:15 | 17 |
| 2022.07.11. 16:30 | 17 |
| 2022.07.11. 16:45 | 17 |
| 2022.07.11. 17:00 | 17 |
| 2022.07.11. 17:15 | 17 |
| 2022.07.11. 17:30 | 17 |
| 2022.07.11. 17:45 | 17 |
| 2022.07.11. 18:00 | 17 |
| 2022.07.11. 18:15 | 17 |
| 2022.07.11. 18:30 | 17 |
| 2022.07.11. 18:45 | 17 |
| 2022.07.11. 19:00 | 17 |
| 2022.07.11. 19:15 | 17 |
| 2022.07.11. 19:30 | 17 |
| 2022.07.11. 19:45 | 17 |
| 2022.07.11. 20:00 | 17 |
| 2022.07.11. 20:15 | 17 |
| 2022.07.11. 20:30 | 17 |
| 2022.07.11. 20:45 | 17 |
| 2022.07.11. 21:00 | 17 |
| 2022.07.11. 21:15 | 17 |
| 2022.07.11. 21:30 | 17 |
| 2022.07.11. 21:45 | 17 |
| 2022.07.11. 22:00 | 17 |
| 2022.07.11. 22:15 | 17 |
| 2022.07.11. 22:30 | 17 |
| 2022.07.11. 22:45 | 17 |
| 2022.07.11. 23:00 | 17 |
| 2022.07.11. 23:15 | 17 |
| 2022.07.11. 23:30 | 17 |
| 2022.07.11. 23:45 | 17 |
| 2022.07.12. 00:00 | 17 |
| 2022.07.12. 00:15 | 17 |
| 2022.07.12. 00:30 | 17 |
| 2022.07.12. 00:45 | 17 |
| 2022.07.12. 01:00 | 17 |
| 2022.07.12. 01:15 | 17 |
| 2022.07.12. 01:30 | 17 |
| 2022.07.12. 01:45 | 17 |
| 2022.07.12. 02:00 | 17 |
| 2022.07.12. 02:15 | 17 |
| 2022.07.12. 02:30 | 17 |
| 2022.07.12. 02:45 | 17 |
| 2022.07.12. 03:00 | 17 |
| 2022.07.12. 03:15 | 17 |
| 2022.07.12. 03:30 | 17 |
| 2022.07.12. 03:45 | 17 |
| 2022.07.12. 04:00 | 17 |
| 2022.07.12. 04:15 | 17 |
| 2022.07.12. 04:30 | 17 |
| 2022.07.12. 04:45 | 17 |
| 2022.07.12. 05:00 | 17 |
| 2022.07.12. 05:15 | 17 |
| 2022.07.12. 05:30 | 17 |
| 2022.07.12. 05:45 | 17 |
| 2022.07.12. 06:00 | 17 |
| 2022.07.12. 06:15 | 17 |
| 2022.07.12. 06:30 | 17 |
| 2022.07.12. 06:45 | 17 |
| 2022.07.12. 07:00 | 17 |
| 2022.07.12. 07:15 | 17 |
| 2022.07.12. 07:30 | 17 |
| 2022.07.12. 07:45 | 17 |
| 2022.07.12. 08:00 | 17 |
| 2022.07.12. 08:15 | 17 |
| 2022.07.12. 08:30 | 17 |
| 2022.07.12. 08:45 | 17 |
| 2022.07.12. 09:00 | 17 |
| 2022.07.12. 09:15 | 17 |
| 2022.07.12. 09:30 | 17 |
| 2022.07.12. 09:45 | 17 |
| 2022.07.12. 10:00 | 17 |
| 2022.07.12. 10:15 | 17 |
| 2022.07.12. 10:30 | 17 |
| 2022.07.12. 10:45 | 17 |
| 2022.07.12. 11:00 | 17 |
| 2022.07.12. 11:15 | 17 |
| 2022.07.12. 11:30 | 17 |
| 2022.07.12. 11:45 | 17 |
| 2022.07.12. 12:00 | 17 |
| 2022.07.12. 12:15 | 17 |
| 2022.07.12. 12:30 | 17 |
| 2022.07.12. 12:45 | 17 |
| 2022.07.12. 13:00 | 17 |
| 2022.07.12. 13:15 | 17 |
| 2022.07.12. 13:30 | 17 |
| 2022.07.12. 13:45 | 17 |
| 2022.07.12. 14:00 | 17 |
| 2022.07.12. 14:15 | 17 |
| 2022.07.12. 14:30 | 17 |
| 2022.07.12. 14:45 | 17 |
| 2022.07.12. 15:00 | 17 |
| 2022.07.12. 15:15 | 17 |
| 2022.07.12. 15:30 | 17 |
| 2022.07.12. 15:45 | 17 |
| 2022.07.12. 16:00 | 17 |
| 2022.07.12. 16:15 | 17 |
| 2022.07.12. 16:30 | 17 |
| 2022.07.12. 16:45 | 17 |
| 2022.07.12. 17:00 | 17 |
| 2022.07.12. 17:15 | 17 |
| 2022.07.12. 17:30 | 17 |
| 2022.07.12. 17:45 | 17 |
| 2022.07.12. 18:00 | 17 |
| 2022.07.12. 18:15 | 17 |
| 2022.07.12. 18:30 | 17 |
| 2022.07.12. 18:45 | 17 |
| 2022.07.12. 19:00 | 17 |
| 2022.07.12. 19:15 | 17 |
| 2022.07.12. 19:30 | 17 |
| 2022.07.12. 19:45 | 17 |
| 2022.07.12. 20:00 | 17 |
| 2022.07.12. 20:15 | 17 |
| 2022.07.12. 20:30 | 17 |
| 2022.07.12. 20:45 | 17 |
| 2022.07.12. 21:00 | 17 |
| 2022.07.12. 21:15 | 17 |
| 2022.07.12. 21:30 | 17 |
| 2022.07.12. 21:45 | 17 |
| 2022.07.12. 22:00 | 17 |
| 2022.07.12. 22:15 | 17 |
| 2022.07.12. 22:30 | 17 |
| 2022.07.12. 22:45 | 17 |
| 2022.07.12. 23:00 | 17 |
| 2022.07.12. 23:15 | 17 |
| 2022.07.12. 23:30 | 17 |
| 2022.07.12. 23:45 | 17 |
| 2022.07.13. 00:00 | 17 |
| 2022.07.13. 00:15 | 17 |
| 2022.07.13. 00:30 | 17 |
| 2022.07.13. 00:45 | 17 |
| 2022.07.13. 01:00 | 17 |
| 2022.07.13. 01:15 | 17 |
| 2022.07.13. 01:30 | 17 |
| 2022.07.13. 01:45 | 17 |
| 2022.07.13. 02:00 | 17 |
| 2022.07.13. 02:15 | 17 |
| 2022.07.13. 02:30 | 17 |
| 2022.07.13. 02:45 | 17 |
| 2022.07.13. 03:00 | 17 |
| 2022.07.13. 03:15 | 17 |
| 2022.07.13. 03:30 | 17 |
| 2022.07.13. 03:45 | 17 |
| 2022.07.13. 04:00 | 17 |
| 2022.07.13. 04:15 | 17 |
| 2022.07.13. 04:30 | 17 |
| 2022.07.13. 04:45 | 17 |
| 2022.07.13. 05:00 | 17 |
| 2022.07.13. 05:15 | 17 |
| 2022.07.13. 05:30 | 17 |
| 2022.07.13. 05:45 | 17 |
| 2022.07.13. 06:00 | 17 |
| 2022.07.13. 06:15 | 17 |
| 2022.07.13. 06:30 | 17 |
| 2022.07.13. 06:45 | 17 |
| 2022.07.13. 07:00 | 17 |
| 2022.07.13. 07:15 | 17 |
| 2022.07.13. 07:30 | 17 |
| 2022.07.13. 07:45 | 17 |
| 2022.07.13. 08:00 | 17 |
| 2022.07.13. 08:15 | 17 |
| 2022.07.13. 08:30 | 17 |
| 2022.07.13. 08:45 | 17 |
| 2022.07.13. 09:00 | 17 |
| 2022.07.13. 09:15 | 17 |
| 2022.07.13. 09:30 | 17 |
| 2022.07.13. 09:45 | 17 |
| 2022.07.13. 10:00 | 17 |
| 2022.07.13. 10:15 | 17 |
| 2022.07.13. 10:30 | 17 |
| 2022.07.13. 10:45 | 17 |
| 2022.07.13. 11:00 | 17 |
| 2022.07.13. 11:15 | 17 |
| 2022.07.13. 11:30 | 17 |
| 2022.07.13. 11:45 | 17 |
| 2022.07.13. 12:00 | 17 |
| 2022.07.13. 12:15 | 17 |
| 2022.07.13. 12:30 | 17 |
| 2022.07.13. 12:45 | 17 |
| 2022.07.13. 13:00 | 17 |
| 2022.07.13. 13:15 | 17 |
| 2022.07.13. 13:30 | 17 |
| 2022.07.13. 13:45 | 17 |
| 2022.07.13. 14:00 | 17 |
| 2022.07.13. 14:15 | 17 |
| 2022.07.13. 14:30 | 17 |
| 2022.07.13. 14:45 | 17 |
| 2022.07.13. 15:00 | 17 |
| 2022.07.13. 15:15 | 17 |
| 2022.07.13. 15:30 | 17 |
| 2022.07.13. 15:45 | 17 |
| 2022.07.13. 16:00 | 17 |
| 2022.07.13. 16:15 | 17 |
| 2022.07.13. 16:30 | 17 |
| 2022.07.13. 16:45 | 17 |
| 2022.07.13. 17:00 | 17 |
| 2022.07.13. 17:15 | 17 |
| 2022.07.13. 17:30 | 17 |
| 2022.07.13. 17:45 | 17 |
| 2022.07.13. 18:00 | 17 |
| 2022.07.13. 18:15 | 17 |
| 2022.07.13. 18:30 | 17 |
| 2022.07.13. 18:45 | 17 |
| 2022.07.13. 19:00 | 17 |
| 2022.07.13. 19:15 | 17 |
| 2022.07.13. 19:30 | 17 |
| 2022.07.13. 19:45 | 17 |
| 2022.07.13. 20:00 | 17 |
| 2022.07.13. 20:15 | 17 |
| 2022.07.13. 20:30 | 17 |
| 2022.07.13. 20:45 | 17 |
| 2022.07.13. 21:00 | 17 |
| 2022.07.13. 21:15 | 17 |
| 2022.07.13. 21:30 | 17 |
| 2022.07.13. 21:45 | 17 |
| 2022.07.13. 22:00 | 17 |
| 2022.07.13. 22:15 | 17 |
| 2022.07.13. 22:30 | 17 |
| 2022.07.13. 22:45 | 17 |
| 2022.07.13. 23:00 | 17 |
| 2022.07.13. 23:15 | 17 |
| 2022.07.13. 23:30 | 17 |
| 2022.07.13. 23:45 | 17 |
| 2022.07.14. 00:00 | 17 |
| 2022.07.14. 00:15 | 17 |
| 2022.07.14. 00:30 | 17 |
| 2022.07.14. 00:45 | 17 |
| 2022.07.14. 01:00 | 17 |
| 2022.07.14. 01:15 | 17 |
| 2022.07.14. 01:30 | 17 |
| 2022.07.14. 01:45 | 17 |
| 2022.07.14. 02:00 | 17 |
| 2022.07.14. 02:15 | 17 |
| 2022.07.14. 02:30 | 17 |
| 2022.07.14. 02:45 | 17 |
| 2022.07.14. 03:00 | 17 |
| 2022.07.14. 03:15 | 17 |
| 2022.07.14. 03:30 | 17 |
| 2022.07.14. 03:45 | 17 |
| 2022.07.14. 04:00 | 17 |
| 2022.07.14. 04:15 | 17 |
| 2022.07.14. 04:30 | 17 |
| 2022.07.14. 04:45 | 17 |
| 2022.07.14. 05:00 | 17 |
| 2022.07.14. 05:15 | 17 |
| 2022.07.14. 05:30 | 17 |
| 2022.07.14. 05:45 | 17 |
| 2022.07.14. 06:00 | 17 |
| 2022.07.14. 06:15 | 17 |
| 2022.07.14. 06:30 | 17 |
| 2022.07.14. 06:45 | 17 |
| 2022.07.14. 07:00 | 17 |
| 2022.07.14. 07:15 | 17 |
| 2022.07.14. 07:30 | 17 |
| 2022.07.14. 07:45 | 17 |
| 2022.07.14. 08:00 | 17 |
| 2022.07.14. 08:15 | 17 |
| 2022.07.14. 08:30 | 17 |
| 2022.07.14. 08:45 | 17 |
| 2022.07.14. 09:00 | 17 |
| 2022.07.14. 09:15 | 17 |
| 2022.07.14. 09:30 | 17 |
| 2022.07.14. 09:45 | 17 |
| 2022.07.14. 10:00 | 17 |
| 2022.07.14. 10:15 | 17 |
| 2022.07.14. 10:30 | 17 |
| 2022.07.14. 10:45 | 17 |
| 2022.07.14. 11:00 | 17 |
| 2022.07.14. 11:15 | 17 |
| 2022.07.14. 11:30 | 17 |
| 2022.07.14. 11:45 | 17 |
| 2022.07.14. 12:00 | 17 |
| 2022.07.14. 12:15 | 17 |
| 2022.07.14. 12:30 | 17 |
| 2022.07.14. 12:45 | 17 |
| 2022.07.14. 13:00 | 17 |
| 2022.07.14. 13:15 | 17 |
| 2022.07.14. 13:30 | 17 |
| 2022.07.14. 13:45 | 17 |
| 2022.07.14. 14:00 | 17 |
| 2022.07.14. 14:15 | 17 |
| 2022.07.14. 14:30 | 17 |
| 2022.07.14. 14:45 | 17 |
| 2022.07.14. 15:00 | 17 |
| 2022.07.14. 15:15 | 17 |
| 2022.07.14. 15:30 | 17 |
| 2022.07.14. 15:45 | 17 |
| 2022.07.14. 16:00 | 17 |
| 2022.07.14. 16:15 | 17 |
| 2022.07.14. 16:30 | 17 |
| 2022.07.14. 16:45 | 17 |
| 2022.07.14. 17:00 | 17 |
| 2022.07.14. 17:15 | 17 |
| 2022.07.14. 17:30 | 17 |
| 2022.07.14. 17:45 | 17 |
| 2022.07.14. 18:00 | 17 |
| 2022.07.14. 18:15 | 17 |
| 2022.07.14. 18:30 | 17 |
| 2022.07.14. 18:45 | 17 |
| 2022.07.14. 19:00 | 17 |
| 2022.07.14. 19:15 | 17 |
| 2022.07.14. 19:30 | 17 |
| 2022.07.14. 19:45 | 17 |
| 2022.07.14. 20:00 | 17 |
| 2022.07.14. 20:15 | 17 |
| 2022.07.14. 20:30 | 17 |
| 2022.07.14. 20:45 | 17 |
| 2022.07.14. 21:00 | 17 |
| 2022.07.14. 21:15 | 17 |
| 2022.07.14. 21:30 | 17 |
| 2022.07.14. 21:45 | 17 |
| 2022.07.14. 22:00 | 17 |
| 2022.07.14. 22:15 | 17 |
| 2022.07.14. 22:30 | 17 |
| 2022.07.14. 22:45 | 17 |
| 2022.07.14. 23:00 | 17 |
| 2022.07.14. 23:15 | 17 |
| 2022.07.14. 23:30 | 17 |
| 2022.07.14. 23:45 | 17 |
| 2022.07.15. 00:00 | 17 |
| 2022.07.15. 00:15 | 17 |
| 2022.07.15. 00:30 | 17 |
| 2022.07.15. 00:45 | 17 |
| 2022.07.15. 01:00 | 17 |
| 2022.07.15. 01:15 | 17 |
| 2022.07.15. 01:30 | 17 |
| 2022.07.15. 01:45 | 17 |
| 2022.07.15. 02:00 | 17 |
| 2022.07.15. 02:15 | 17 |
| 2022.07.15. 02:30 | 17 |
| 2022.07.15. 02:45 | 17 |
| 2022.07.15. 03:00 | 17 |
| 2022.07.15. 03:15 | 17 |
| 2022.07.15. 03:30 | 17 |
| 2022.07.15. 03:45 | 17 |
| 2022.07.15. 04:00 | 17 |
| 2022.07.15. 04:15 | 17 |
| 2022.07.15. 04:30 | 17 |
| 2022.07.15. 04:45 | 17 |
| 2022.07.15. 05:00 | 17 |
| 2022.07.15. 05:15 | 17 |
| 2022.07.15. 05:30 | 17 |
| 2022.07.15. 05:45 | 17 |
| 2022.07.15. 06:00 | 17 |
| 2022.07.15. 06:15 | 17 |
| 2022.07.15. 06:30 | 17 |
| 2022.07.15. 06:45 | 17 |
| 2022.07.15. 07:00 | 17 |
| 2022.07.15. 07:15 | 17 |
| 2022.07.15. 07:30 | 17 |
| 2022.07.15. 07:45 | 17 |
| 2022.07.15. 08:00 | 17 |
| 2022.07.15. 08:15 | 17 |
| 2022.07.15. 08:30 | 17 |
| 2022.07.15. 08:45 | 17 |
| 2022.07.15. 09:00 | 17 |
| 2022.07.15. 09:15 | 17 |
| 2022.07.15. 09:30 | 17 |
| 2022.07.15. 09:45 | 17 |
| 2022.07.15. 10:00 | 17 |
| 2022.07.15. 10:15 | 17 |
| 2022.07.15. 10:30 | 17 |
| 2022.07.15. 10:45 | 17 |
| 2022.07.15. 11:00 | 17 |
| 2022.07.15. 11:15 | 17 |
| 2022.07.15. 11:30 | 17 |
| 2022.07.15. 11:45 | 17 |
| 2022.07.15. 12:00 | 17 |
| 2022.07.15. 12:15 | 17 |
| 2022.07.15. 12:30 | 17 |
| 2022.07.15. 12:45 | 17 |
| 2022.07.15. 13:00 | 17 |
| 2022.07.15. 13:15 | 17 |
| 2022.07.15. 13:30 | 17 |
| 2022.07.15. 13:45 | 17 |
| 2022.07.15. 14:00 | 17 |
| 2022.07.15. 14:15 | 17 |
| 2022.07.15. 14:30 | 17 |
| 2022.07.15. 14:45 | 17 |
| 2022.07.15. 15:00 | 17 |
| 2022.07.15. 15:15 | 17 |
| 2022.07.15. 15:30 | 17 |
| 2022.07.15. 15:45 | 17 |
| 2022.07.15. 16:00 | 17 |
| 2022.07.15. 16:15 | 17 |
| 2022.07.15. 16:30 | 17 |
| 2022.07.15. 16:45 | 17 |
| 2022.07.15. 17:00 | 17 |
| 2022.07.15. 17:15 | 17 |
| 2022.07.15. 17:30 | 17 |
| 2022.07.15. 17:45 | 17 |
| 2022.07.15. 18:00 | 17 |
| 2022.07.15. 18:15 | 17 |
| 2022.07.15. 18:30 | 17 |
| 2022.07.15. 18:45 | 17 |
| 2022.07.15. 19:00 | 17 |
| 2022.07.15. 19:15 | 17 |
| 2022.07.15. 19:30 | 17 |
| 2022.07.15. 19:45 | 17 |
| 2022.07.15. 20:00 | 17 |
| 2022.07.15. 20:15 | 17 |
| 2022.07.15. 20:30 | 17 |
| 2022.07.15. 20:45 | 17 |
| 2022.07.15. 21:00 | 17 |
| 2022.07.15. 21:15 | 17 |
| 2022.07.15. 21:30 | 17 |
| 2022.07.15. 21:45 | 17 |
| 2022.07.15. 22:00 | 17 |
| 2022.07.15. 22:15 | 17 |
| 2022.07.15. 22:30 | 17 |
| 2022.07.15. 22:45 | 17 |
| 2022.07.15. 23:00 | 17 |
| 2022.07.15. 23:15 | 17 |
| 2022.07.15. 23:30 | 17 |
| 2022.07.15. 23:45 | 17 |
| 2022.07.16. 00:00 | 17 |
| 2022.07.16. 00:15 | 17 |
| 2022.07.16. 00:30 | 17 |
| 2022.07.16. 00:45 | 17 |
| 2022.07.16. 01:00 | 17 |
| 2022.07.16. 01:15 | 17 |
| 2022.07.16. 01:30 | 17 |
| 2022.07.16. 01:45 | 17 |
| 2022.07.16. 02:00 | 17 |
| 2022.07.16. 02:15 | 17 |
| 2022.07.16. 02:30 | 17 |
| 2022.07.16. 02:45 | 17 |
| 2022.07.16. 03:00 | 17 |
| 2022.07.16. 03:15 | 17 |
| 2022.07.16. 03:30 | 17 |
| 2022.07.16. 03:45 | 17 |
| 2022.07.16. 04:00 | 17 |
| 2022.07.16. 04:15 | 17 |
| 2022.07.16. 04:30 | 17 |
| 2022.07.16. 04:45 | 17 |
| 2022.07.16. 05:00 | 17 |
| 2022.07.16. 05:15 | 17 |
| 2022.07.16. 05:30 | 17 |
| 2022.07.16. 05:45 | 17 |
| 2022.07.16. 06:00 | 17 |
| 2022.07.16. 06:15 | 17 |
| 2022.07.16. 06:30 | 17 |
| 2022.07.16. 06:45 | 17 |
| 2022.07.16. 07:00 | 17 |
| 2022.07.16. 07:15 | 17 |
| 2022.07.16. 07:30 | 17 |
| 2022.07.16. 07:45 | 17 |
| 2022.07.16. 08:00 | 17 |
| 2022.07.16. 08:15 | 17 |
| 2022.07.16. 08:30 | 17 |
| 2022.07.16. 08:45 | 17 |
| 2022.07.16. 09:00 | 17 |
| 2022.07.16. 09:15 | 17 |
| 2022.07.16. 09:30 | 17 |
| 2022.07.16. 09:45 | 17 |
| 2022.07.16. 10:00 | 17 |
| 2022.07.16. 10:15 | 17 |
| 2022.07.16. 10:30 | 17 |
| 2022.07.16. 10:45 | 17 |
| 2022.07.16. 11:00 | 17 |
| 2022.07.16. 11:15 | 17 |
| 2022.07.16. 11:30 | 17 |
| 2022.07.16. 11:45 | 17 |
| 2022.07.16. 12:00 | 17 |
| 2022.07.16. 12:15 | 17 |
| 2022.07.16. 12:30 | 17 |
| 2022.07.16. 12:45 | 17 |
| 2022.07.16. 13:00 | 17 |
| 2022.07.16. 13:15 | 17 |
| 2022.07.16. 13:30 | 17 |
| 2022.07.16. 13:45 | 17 |
| 2022.07.16. 14:00 | 17 |
| 2022.07.16. 14:15 | 17 |
| 2022.07.16. 14:30 | 17 |
| 2022.07.16. 14:45 | 17 |
| 2022.07.16. 15:00 | 17 |
| 2022.07.16. 15:15 | 17 |
| 2022.07.16. 15:30 | 17 |
| 2022.07.16. 15:45 | 17 |
| 2022.07.16. 16:00 | 17 |
| 2022.07.16. 16:15 | 17 |
| 2022.07.16. 16:30 | 17 |
| 2022.07.16. 16:45 | 17 |
| 2022.07.16. 17:00 | 17 |
| 2022.07.16. 17:15 | 17 |
| 2022.07.16. 17:30 | 17 |
| 2022.07.16. 17:45 | 17 |
| 2022.07.16. 18:00 | 17 |
| 2022.07.16. 18:15 | 17 |
| 2022.07.16. 18:30 | 17 |
| 2022.07.16. 18:45 | 17 |
| 2022.07.16. 19:00 | 17 |
| 2022.07.16. 19:15 | 17 |
| 2022.07.16. 19:30 | 17 |
| 2022.07.16. 19:45 | 17 |
| 2022.07.16. 20:00 | 17 |
| 2022.07.16. 20:15 | 17 |
| 2022.07.16. 20:30 | 17 |
| 2022.07.16. 20:45 | 17 |
| 2022.07.16. 21:00 | 17 |
| 2022.07.16. 21:15 | 17 |
| 2022.07.16. 21:30 | 17 |
| 2022.07.16. 21:45 | 17 |
| 2022.07.16. 22:00 | 17 |
| 2022.07.16. 22:15 | 17 |
| 2022.07.16. 22:30 | 17 |
| 2022.07.16. 22:45 | 17 |
| 2022.07.16. 23:00 | 17 |
| 2022.07.16. 23:15 | 17 |
| 2022.07.16. 23:30 | 17 |
| 2022.07.16. 23:45 | 17 |
| 2022.07.17. 00:00 | 17 |
| 2022.07.17. 00:15 | 17 |
| 2022.07.17. 00:30 | 17 |
| 2022.07.17. 00:45 | 17 |
| 2022.07.17. 01:00 | 17 |
| 2022.07.17. 01:15 | 17 |
| 2022.07.17. 01:30 | 17 |
| 2022.07.17. 01:45 | 17 |
| 2022.07.17. 02:00 | 17 |
| 2022.07.17. 02:15 | 17 |
| 2022.07.17. 02:30 | 17 |
| 2022.07.17. 02:45 | 17 |
| 2022.07.17. 03:00 | 17 |
| 2022.07.17. 03:15 | 17 |
| 2022.07.17. 03:30 | 17 |
| 2022.07.17. 03:45 | 17 |
| 2022.07.17. 04:00 | 17 |
| 2022.07.17. 04:15 | 17 |
| 2022.07.17. 04:30 | 17 |
| 2022.07.17. 04:45 | 17 |
| 2022.07.17. 05:00 | 17 |
| 2022.07.17. 05:15 | 17 |
| 2022.07.17. 05:30 | 17 |
| 2022.07.17. 05:45 | 17 |
| 2022.07.17. 06:00 | 17 |
| 2022.07.17. 06:15 | 17 |
| 2022.07.17. 06:30 | 17 |
| 2022.07.17. 06:45 | 17 |
| 2022.07.17. 07:00 | 17 |
| 2022.07.17. 07:15 | 17 |
| 2022.07.17. 07:30 | 17 |
| 2022.07.17. 07:45 | 17 |
| 2022.07.17. 08:00 | 17 |
| 2022.07.17. 08:15 | 17 |
| 2022.07.17. 08:30 | 17 |
| 2022.07.17. 08:45 | 17 |
| 2022.07.17. 09:00 | 17 |
| 2022.07.17. 09:15 | 17 |
| 2022.07.17. 09:30 | 17 |
| 2022.07.17. 09:45 | 17 |
| 2022.07.17. 10:00 | 17 |
| 2022.07.17. 10:15 | 17 |
| 2022.07.17. 10:30 | 17 |
| 2022.07.17. 10:45 | 17 |
| 2022.07.17. 11:00 | 17 |
| 2022.07.17. 11:15 | 17 |
| 2022.07.17. 11:30 | 17 |
| 2022.07.17. 11:45 | 17 |
| 2022.07.17. 12:00 | 17 |
| 2022.07.17. 12:15 | 17 |
| 2022.07.17. 12:30 | 17 |
| 2022.07.17. 12:45 | 17 |
| 2022.07.17. 13:00 | 17 |
| 2022.07.17. 13:15 | 17 |
| 2022.07.17. 13:30 | 17 |
| 2022.07.17. 13:45 | 17 |
| 2022.07.17. 14:00 | 17 |
| 2022.07.17. 14:15 | 17 |
| 2022.07.17. 14:30 | 17 |
| 2022.07.17. 14:45 | 17 |
| 2022.07.17. 15:00 | 17 |
| 2022.07.17. 15:15 | 17 |
| 2022.07.17. 15:30 | 17 |
| 2022.07.17. 15:45 | 17 |
| 2022.07.17. 16:00 | 17 |
| 2022.07.17. 16:15 | 17 |
| 2022.07.17. 16:30 | 17 |
| 2022.07.17. 16:45 | 17 |
| 2022.07.17. 17:00 | 17 |
| 2022.07.17. 17:15 | 17 |
| 2022.07.17. 17:30 | 17 |
| 2022.07.17. 17:45 | 17 |
| 2022.07.17. 18:00 | 17 |
| 2022.07.17. 18:15 | 17 |
| 2022.07.17. 18:30 | 17 |
| 2022.07.17. 18:45 | 17 |
| 2022.07.17. 19:00 | 17 |
| 2022.07.17. 19:15 | 17 |
| 2022.07.17. 19:30 | 17 |
| 2022.07.17. 19:45 | 17 |
| 2022.07.17. 20:00 | 17 |
| 2022.07.17. 20:15 | 17 |
| 2022.07.17. 20:30 | 17 |
| 2022.07.17. 20:45 | 17 |
| 2022.07.17. 21:00 | 17 |
| 2022.07.17. 21:15 | 17 |
| 2022.07.17. 21:30 | 17 |
| 2022.07.17. 21:45 | 17 |
| 2022.07.17. 22:00 | 17 |
| 2022.07.17. 22:15 | 17 |
| 2022.07.17. 22:30 | 17 |
| 2022.07.17. 22:45 | 17 |
| 2022.07.17. 23:00 | 17 |
| 2022.07.17. 23:15 | 17 |
| 2022.07.17. 23:30 | 17 |
| 2022.07.17. 23:45 | 17 |
| 2022.07.18. 00:00 | 17 |
| 2022.07.18. 00:15 | 17 |
| 2022.07.18. 00:30 | 17 |
| 2022.07.18. 00:45 | 17 |
| 2022.07.18. 01:00 | 17 |
| 2022.07.18. 01:15 | 17 |
| 2022.07.18. 01:30 | 17 |
| 2022.07.18. 01:45 | 17 |
| 2022.07.18. 02:00 | 17 |
| 2022.07.18. 02:15 | 17 |
| 2022.07.18. 02:30 | 17 |
| 2022.07.18. 02:45 | 17 |
| 2022.07.18. 03:00 | 17 |
| 2022.07.18. 03:15 | 17 |
| 2022.07.18. 03:30 | 17 |
| 2022.07.18. 03:45 | 17 |
| 2022.07.18. 04:00 | 17 |
| 2022.07.18. 04:15 | 17 |
| 2022.07.18. 04:30 | 17 |
| 2022.07.18. 04:45 | 17 |
| 2022.07.18. 05:00 | 17 |
| 2022.07.18. 05:15 | 17 |
| 2022.07.18. 05:30 | 17 |
| 2022.07.18. 05:45 | 17 |
| 2022.07.18. 06:00 | 17 |
| 2022.07.18. 06:15 | 17 |
| 2022.07.18. 06:30 | 17 |
| 2022.07.18. 06:45 | 17 |
| 2022.07.18. 07:00 | 17 |
| 2022.07.18. 07:15 | 17 |
| 2022.07.18. 07:30 | 17 |
| 2022.07.18. 07:45 | 17 |
| 2022.07.18. 08:00 | 17 |
| 2022.07.18. 08:15 | 17 |
| 2022.07.18. 08:30 | 17 |
| 2022.07.18. 08:45 | 17 |
| 2022.07.18. 09:00 | 17 |
| 2022.07.18. 09:15 | 17 |
| 2022.07.18. 09:30 | 17 |
| 2022.07.18. 09:45 | 17 |
| 2022.07.18. 10:00 | 17 |
| 2022.07.18. 10:15 | 17 |
| 2022.07.18. 10:30 | 17 |
| 2022.07.18. 10:45 | 17 |
| 2022.07.18. 11:00 | 17 |
| 2022.07.18. 11:15 | 17 |
| 2022.07.18. 11:30 | 17 |
| 2022.07.18. 11:45 | 17 |
| 2022.07.18. 12:00 | 17 |
| 2022.07.18. 12:15 | 17 |
| 2022.07.18. 12:30 | 17 |
| 2022.07.18. 12:45 | 17 |
| 2022.07.18. 13:00 | 17 |
| 2022.07.18. 13:15 | 17 |
| 2022.07.18. 13:30 | 17 |
| 2022.07.18. 13:45 | 17 |
| 2022.07.18. 14:00 | 17 |
| 2022.07.18. 14:15 | 17 |
| 2022.07.18. 14:30 | 17 |
| 2022.07.18. 14:45 | 17 |
| 2022.07.18. 15:00 | 17 |
| 2022.07.18. 15:15 | 17 |
| 2022.07.18. 15:30 | 17 |
| 2022.07.18. 15:45 | 17 |
| 2022.07.18. 16:00 | 17 |
| 2022.07.18. 16:15 | 17 |
| 2022.07.18. 16:30 | 17 |
| 2022.07.18. 16:45 | 17 |
| 2022.07.18. 17:00 | 17 |
| 2022.07.18. 17:15 | 17 |
| 2022.07.18. 17:30 | 17 |
| 2022.07.18. 17:45 | 17 |
| 2022.07.18. 18:00 | 17 |
| 2022.07.18. 18:15 | 17 |
| 2022.07.18. 18:30 | 17 |
| 2022.07.18. 18:45 | 17 |
| 2022.07.18. 19:00 | 17 |
| 2022.07.18. 19:15 | 17 |
| 2022.07.18. 19:30 | 17 |
| 2022.07.18. 19:45 | 17 |
| 2022.07.18. 20:00 | 17 |
| 2022.07.18. 20:15 | 17 |
| 2022.07.18. 20:30 | 17 |
| 2022.07.18. 20:45 | 17 |
| 2022.07.18. 21:00 | 17 |
| 2022.07.18. 21:15 | 17 |
| 2022.07.18. 21:30 | 17 |
| 2022.07.18. 21:45 | 17 |
| 2022.07.18. 22:00 | 17 |
| 2022.07.18. 22:15 | 17 |
| 2022.07.18. 22:30 | 17 |
| 2022.07.18. 22:45 | 17 |
| 2022.07.18. 23:00 | 17 |
| 2022.07.18. 23:15 | 17 |
| 2022.07.18. 23:30 | 17 |
| 2022.07.18. 23:45 | 17 |
| 2022.07.19. 00:00 | 17 |
| 2022.07.19. 00:15 | 17 |
| 2022.07.19. 00:30 | 17 |
| 2022.07.19. 00:45 | 17 |
| 2022.07.19. 01:00 | 17 |
| 2022.07.19. 01:15 | 17 |
| 2022.07.19. 01:30 | 17 |
| 2022.07.19. 01:45 | 17 |
| 2022.07.19. 02:00 | 17 |
| 2022.07.19. 02:15 | 17 |
| 2022.07.19. 02:30 | 17 |
| 2022.07.19. 02:45 | 17 |
| 2022.07.19. 03:00 | 17 |
| 2022.07.19. 03:15 | 17 |
| 2022.07.19. 03:30 | 17 |
| 2022.07.19. 03:45 | 17 |
| 2022.07.19. 04:00 | 17 |
| 2022.07.19. 04:15 | 17 |
| 2022.07.19. 04:30 | 17 |
| 2022.07.19. 04:45 | 17 |
| 2022.07.19. 05:00 | 17 |
| 2022.07.19. 05:15 | 17 |
| 2022.07.19. 05:30 | 17 |
| 2022.07.19. 05:45 | 17 |
| 2022.07.19. 06:00 | 17 |
| 2022.07.19. 06:15 | 17 |
| 2022.07.19. 06:30 | 17 |
| 2022.07.19. 06:45 | 17 |
| 2022.07.19. 07:00 | 17 |
| 2022.07.19. 07:15 | 17 |
| 2022.07.19. 07:30 | 17 |
| 2022.07.19. 07:45 | 17 |
| 2022.07.19. 08:00 | 17 |
| 2022.07.19. 08:15 | 17 |
| 2022.07.19. 08:30 | 17 |
| 2022.07.19. 08:45 | 17 |
| 2022.07.19. 09:00 | 17 |
| 2022.07.19. 09:15 | 17 |
| 2022.07.19. 09:30 | 17 |
| 2022.07.19. 09:45 | 17 |
| 2022.07.19. 10:00 | 17 |
| 2022.07.19. 10:15 | 17 |
| 2022.07.19. 10:30 | 17 |
| 2022.07.19. 10:45 | 17 |
| 2022.07.19. 11:00 | 17 |
| 2022.07.19. 11:15 | 17 |
| 2022.07.19. 11:30 | 17 |
| 2022.07.19. 11:45 | 17 |
| 2022.07.19. 12:00 | 17 |
| 2022.07.19. 12:15 | 17 |
| 2022.07.19. 12:30 | 17 |
| 2022.07.19. 12:45 | 17 |
| 2022.07.19. 13:00 | 17 |
| 2022.07.19. 13:15 | 17 |
| 2022.07.19. 13:30 | 17 |
| 2022.07.19. 13:45 | 17 |
| 2022.07.19. 14:00 | 17 |
| 2022.07.19. 14:15 | 17 |
| 2022.07.19. 14:30 | 17 |
| 2022.07.19. 14:45 | 17 |
| 2022.07.19. 15:00 | 17 |
| 2022.07.19. 15:15 | 17 |
| 2022.07.19. 15:30 | 17 |
| 2022.07.19. 15:45 | 17 |
| 2022.07.19. 16:00 | 17 |
| 2022.07.19. 16:15 | 17 |
| 2022.07.19. 16:30 | 17 |
| 2022.07.19. 16:45 | 17 |
| 2022.07.19. 17:00 | 17 |
| 2022.07.19. 17:15 | 17 |
| 2022.07.19. 17:30 | 17 |
| 2022.07.19. 17:45 | 17 |
| 2022.07.19. 18:00 | 17 |
| 2022.07.19. 18:15 | 17 |
| 2022.07.19. 18:30 | 17 |
| 2022.07.19. 18:45 | 17 |
| 2022.07.19. 19:00 | 17 |
| 2022.07.19. 19:15 | 17 |
| 2022.07.19. 19:30 | 17 |
| 2022.07.19. 19:45 | 17 |
| 2022.07.19. 20:00 | 17 |
| 2022.07.19. 20:15 | 17 |
| 2022.07.19. 20:30 | 17 |
| 2022.07.19. 20:45 | 17 |
| 2022.07.19. 21:00 | 17 |
| 2022.07.19. 21:15 | 17 |
| 2022.07.19. 21:30 | 17 |
| 2022.07.19. 21:45 | 17 |
| 2022.07.19. 22:00 | 17 |
| 2022.07.19. 22:15 | 17 |
| 2022.07.19. 22:30 | 17 |
| 2022.07.19. 22:45 | 17 |
| 2022.07.19. 23:00 | 17 |
| 2022.07.19. 23:15 | 17 |
| 2022.07.19. 23:30 | 17 |
| 2022.07.19. 23:45 | 17 |
| 2022.07.20. 00:00 | 17 |
| 2022.07.20. 00:15 | 17 |
| 2022.07.20. 00:30 | 17 |
| 2022.07.20. 00:45 | 17 |
| 2022.07.20. 01:00 | 17 |
| 2022.07.20. 01:15 | 17 |
| 2022.07.20. 01:30 | 17 |
| 2022.07.20. 01:45 | 17 |
| 2022.07.20. 02:00 | 17 |
| 2022.07.20. 02:15 | 17 |
| 2022.07.20. 02:30 | 17 |
| 2022.07.20. 02:45 | 17 |
| 2022.07.20. 03:00 | 17 |
| 2022.07.20. 03:15 | 17 |
| 2022.07.20. 03:30 | 17 |
| 2022.07.20. 03:45 | 17 |
| 2022.07.20. 04:00 | 17 |
| 2022.07.20. 04:15 | 17 |
| 2022.07.20. 04:30 | 17 |
| 2022.07.20. 04:45 | 17 |
| 2022.07.20. 05:00 | 17 |
| 2022.07.20. 05:15 | 17 |
| 2022.07.20. 05:30 | 17 |
| 2022.07.20. 05:45 | 17 |
| 2022.07.20. 06:00 | 17 |
| 2022.07.20. 06:15 | 17 |
| 2022.07.20. 06:30 | 17 |
| 2022.07.20. 06:45 | 17 |
| 2022.07.20. 07:00 | 17 |
| 2022.07.20. 07:15 | 17 |
| 2022.07.20. 07:30 | 17 |
| 2022.07.20. 07:45 | 17 |
| 2022.07.20. 08:00 | 17 |
| 2022.07.20. 08:15 | 17 |
| 2022.07.20. 08:30 | 17 |
| 2022.07.20. 08:45 | 17 |
| 2022.07.20. 09:00 | 17 |
| 2022.07.20. 09:15 | 17 |
| 2022.07.20. 09:30 | 17 |
| 2022.07.20. 09:45 | 17 |
| 2022.07.20. 10:00 | 17 |
| 2022.07.20. 10:15 | 17 |
| 2022.07.20. 10:30 | 17 |
| 2022.07.20. 10:45 | 17 |
| 2022.07.20. 11:00 | 17 |
| 2022.07.20. 11:15 | 17 |
| 2022.07.20. 11:30 | 17 |
| 2022.07.20. 11:45 | 17 |
| 2022.07.20. 12:00 | 17 |
| 2022.07.20. 12:15 | 17 |
| 2022.07.20. 12:30 | 17 |
| 2022.07.20. 12:45 | 17 |
| 2022.07.20. 13:00 | 17 |
| 2022.07.20. 13:15 | 17 |
| 2022.07.20. 13:30 | 17 |
| 2022.07.20. 13:45 | 17 |
| 2022.07.20. 14:00 | 17 |
| 2022.07.20. 14:15 | 17 |
| 2022.07.20. 14:30 | 17 |
| 2022.07.20. 14:45 | 17 |
| 2022.07.20. 15:00 | 17 |
| 2022.07.20. 15:15 | 17 |
| 2022.07.20. 15:30 | 17 |
| 2022.07.20. 15:45 | 17 |
| 2022.07.20. 16:00 | 17 |
| 2022.07.20. 16:15 | 17 |
| 2022.07.20. 16:30 | 17 |
| 2022.07.20. 16:45 | 17 |
| 2022.07.20. 17:00 | 17 |
| 2022.07.20. 17:15 | 17 |
| 2022.07.20. 17:30 | 17 |
| 2022.07.20. 17:45 | 17 |
| 2022.07.20. 18:00 | 17 |
| 2022.07.20. 18:15 | 17 |
| 2022.07.20. 18:30 | 17 |
| 2022.07.20. 18:45 | 17 |
| 2022.07.20. 19:00 | 17 |
| 2022.07.20. 19:15 | 17 |
| 2022.07.20. 19:30 | 17 |
| 2022.07.20. 19:45 | 17 |
| 2022.07.20. 20:00 | 17 |
| 2022.07.20. 20:15 | 17 |
| 2022.07.20. 20:30 | 17 |
| 2022.07.20. 20:45 | 17 |
| 2022.07.20. 21:00 | 17 |
| 2022.07.20. 21:15 | 17 |
| 2022.07.20. 21:30 | 17 |
| 2022.07.20. 21:45 | 17 |
| 2022.07.20. 22:00 | 17 |
| 2022.07.20. 22:15 | 17 |
| 2022.07.20. 22:30 | 17 |
| 2022.07.20. 22:45 | 17 |
| 2022.07.20. 23:00 | 17 |
| 2022.07.20. 23:15 | 17 |
| 2022.07.20. 23:30 | 17 |
| 2022.07.20. 23:45 | 17 |
| 2022.07.21. 00:00 | 17 |
| 2022.07.21. 00:15 | 17 |
| 2022.07.21. 00:30 | 17 |
| 2022.07.21. 00:45 | 17 |
| 2022.07.21. 01:00 | 17 |
| 2022.07.21. 01:15 | 17 |
| 2022.07.21. 01:30 | 17 |
| 2022.07.21. 01:45 | 17 |
| 2022.07.21. 02:00 | 17 |
| 2022.07.21. 02:15 | 17 |
| 2022.07.21. 02:30 | 17 |
| 2022.07.21. 02:45 | 17 |
| 2022.07.21. 03:00 | 17 |
| 2022.07.21. 03:15 | 17 |
| 2022.07.21. 03:30 | 17 |
| 2022.07.21. 03:45 | 17 |
| 2022.07.21. 04:00 | 17 |
| 2022.07.21. 04:15 | 17 |
| 2022.07.21. 04:30 | 17 |
| 2022.07.21. 04:45 | 17 |
| 2022.07.21. 05:00 | 17 |
| 2022.07.21. 05:15 | 17 |
| 2022.07.21. 05:30 | 17 |
| 2022.07.21. 05:45 | 17 |
| 2022.07.21. 06:00 | 17 |
| 2022.07.21. 06:15 | 17 |
| 2022.07.21. 06:30 | 17 |
| 2022.07.21. 06:45 | 17 |
| 2022.07.21. 07:00 | 17 |
| 2022.07.21. 07:15 | 17 |
| 2022.07.21. 07:30 | 17 |
| 2022.07.21. 07:45 | 17 |
| 2022.07.21. 08:00 | 17 |
| 2022.07.21. 08:15 | 17 |
| 2022.07.21. 08:30 | 17 |
| 2022.07.21. 08:45 | 17 |
| 2022.07.21. 09:00 | 17 |
| 2022.07.21. 09:15 | 17 |
| 2022.07.21. 09:30 | 17 |
| 2022.07.21. 09:45 | 17 |
| 2022.07.21. 10:00 | 17 |
| 2022.07.21. 10:15 | 17 |
| 2022.07.21. 10:30 | 17 |
| 2022.07.21. 10:45 | 17 |
| 2022.07.21. 11:00 | 17 |
| 2022.07.21. 11:15 | 17 |
| 2022.07.21. 11:30 | 17 |
| 2022.07.21. 11:45 | 17 |
| 2022.07.21. 12:00 | 17 |
| 2022.07.21. 12:15 | 17 |
| 2022.07.21. 12:30 | 17 |
| 2022.07.21. 12:45 | 17 |
| 2022.07.21. 13:00 | 17 |
| 2022.07.21. 13:15 | 17 |
| 2022.07.21. 13:30 | 17 |
| 2022.07.21. 13:45 | 17 |
| 2022.07.21. 14:00 | 17 |
| 2022.07.21. 14:15 | 17 |
| 2022.07.21. 14:30 | 17 |
| 2022.07.21. 14:45 | 17 |
| 2022.07.21. 15:00 | 17 |
| 2022.07.21. 15:15 | 17 |
| 2022.07.21. 15:30 | 17 |
| 2022.07.21. 15:45 | 17 |
| 2022.07.21. 16:00 | 17 |
| 2022.07.21. 16:15 | 17 |
| 2022.07.21. 16:30 | 17 |
| 2022.07.21. 16:45 | 17 |
| 2022.07.21. 17:00 | 17 |
| 2022.07.21. 17:15 | 17 |
| 2022.07.21. 17:30 | 17 |
| 2022.07.21. 17:45 | 17 |
| 2022.07.21. 18:00 | 17 |
| 2022.07.21. 18:15 | 17 |
| 2022.07.21. 18:30 | 17 |
| 2022.07.21. 18:45 | 17 |
| 2022.07.21. 19:00 | 17 |
| 2022.07.21. 19:15 | 17 |
| 2022.07.21. 19:30 | 17 |
| 2022.07.21. 19:45 | 17 |
| 2022.07.21. 20:00 | 17 |
| 2022.07.21. 20:15 | 17 |
| 2022.07.21. 20:30 | 17 |
| 2022.07.21. 20:45 | 17 |
| 2022.07.21. 21:00 | 17 |
| 2022.07.21. 21:15 | 17 |
| 2022.07.21. 21:30 | 17 |
| 2022.07.21. 21:45 | 17 |
| 2022.07.21. 22:00 | 17 |
| 2022.07.21. 22:15 | 17 |
| 2022.07.21. 22:30 | 17 |
| 2022.07.21. 22:45 | 17 |
| 2022.07.21. 23:00 | 17 |
| 2022.07.21. 23:15 | 17 |
| 2022.07.21. 23:30 | 17 |
| 2022.07.21. 23:45 | 17 |
| 2022.07.22. 00:00 | 17 |
| 2022.07.22. 00:15 | 17 |
| 2022.07.22. 00:30 | 17 |
| 2022.07.22. 00:45 | 17 |
| 2022.07.22. 01:00 | 17 |
| 2022.07.22. 01:15 | 17 |
| 2022.07.22. 01:30 | 17 |
| 2022.07.22. 01:45 | 17 |
| 2022.07.22. 02:00 | 17 |
| 2022.07.22. 02:15 | 17 |
| 2022.07.22. 02:30 | 17 |
| 2022.07.22. 02:45 | 17 |
| 2022.07.22. 03:00 | 17 |
| 2022.07.22. 03:15 | 17 |
| 2022.07.22. 03:30 | 17 |
| 2022.07.22. 03:45 | 17 |
| 2022.07.22. 04:00 | 17 |
| 2022.07.22. 04:15 | 17 |
| 2022.07.22. 04:30 | 17 |
| 2022.07.22. 04:45 | 17 |
| 2022.07.22. 05:00 | 17 |
| 2022.07.22. 05:15 | 17 |
| 2022.07.22. 05:30 | 17 |
| 2022.07.22. 05:45 | 17 |
| 2022.07.22. 06:00 | 17 |
| 2022.07.22. 06:15 | 17 |
| 2022.07.22. 06:30 | 17 |
| 2022.07.22. 06:45 | 17 |
| 2022.07.22. 07:00 | 17 |
| 2022.07.22. 07:15 | 17 |
| 2022.07.22. 07:30 | 17 |
| 2022.07.22. 07:45 | 17 |
| 2022.07.22. 08:00 | 17 |
| 2022.07.22. 08:15 | 17 |
| 2022.07.22. 08:30 | 17 |
| 2022.07.22. 08:45 | 17 |
| 2022.07.22. 09:00 | 17 |
| 2022.07.22. 09:15 | 17 |
| 2022.07.22. 09:30 | 17 |
| 2022.07.22. 09:45 | 17 |
| 2022.07.22. 10:00 | 17 |
| 2022.07.22. 10:15 | 17 |
| 2022.07.22. 10:30 | 17 |
| 2022.07.22. 10:45 | 17 |
| 2022.07.22. 11:00 | 17 |
| 2022.07.22. 11:15 | 17 |
| 2022.07.22. 11:30 | 17 |
| 2022.07.22. 11:45 | 17 |
| 2022.07.22. 12:00 | 17 |
| 2022.07.22. 12:15 | 17 |
| 2022.07.22. 12:30 | 17 |
| 2022.07.22. 12:45 | 17 |
| 2022.07.22. 13:00 | 17 |
| 2022.07.22. 13:15 | 17 |
| 2022.07.22. 13:30 | 17 |
| 2022.07.22. 13:45 | 17 |
| 2022.07.22. 14:00 | 17 |
| 2022.07.22. 14:15 | 17 |
| 2022.07.22. 14:30 | 17 |
| 2022.07.22. 14:45 | 17 |
| 2022.07.22. 15:00 | 17 |
| 2022.07.22. 15:15 | 17 |
| 2022.07.22. 15:30 | 17 |
| 2022.07.22. 15:45 | 17 |
| 2022.07.22. 16:00 | 17 |
| 2022.07.22. 16:15 | 17 |
| 2022.07.22. 16:30 | 17 |
| 2022.07.22. 16:45 | 17 |
| 2022.07.22. 17:00 | 17 |
| 2022.07.22. 17:15 | 17 |
| 2022.07.22. 17:30 | 17 |
| 2022.07.22. 17:45 | 17 |
| 2022.07.22. 18:00 | 17 |
| 2022.07.22. 18:15 | 17 |
| 2022.07.22. 18:30 | 17 |
| 2022.07.22. 18:45 | 17 |
| 2022.07.22. 19:00 | 17 |
| 2022.07.22. 19:15 | 17 |
| 2022.07.22. 19:30 | 17 |
| 2022.07.22. 19:45 | 17 |
| 2022.07.22. 20:00 | 17 |
| 2022.07.22. 20:15 | 17 |
| 2022.07.22. 20:30 | 17 |
| 2022.07.22. 20:45 | 17 |
| 2022.07.22. 21:00 | 17 |
| 2022.07.22. 21:15 | 17 |
| 2022.07.22. 21:30 | 17 |
| 2022.07.22. 21:45 | 17 |
| 2022.07.22. 22:00 | 17 |
| 2022.07.22. 22:15 | 17 |
| 2022.07.22. 22:30 | 17 |
| 2022.07.22. 22:45 | 17 |
| 2022.07.22. 23:00 | 17 |
| 2022.07.22. 23:15 | 17 |
| 2022.07.22. 23:30 | 17 |
| 2022.07.22. 23:45 | 17 |
| 2022.07.23. 00:00 | 17 |
| 2022.07.23. 00:15 | 17 |
| 2022.07.23. 00:30 | 17 |
| 2022.07.23. 00:45 | 17 |
| 2022.07.23. 01:00 | 17 |
| 2022.07.23. 01:15 | 17 |
| 2022.07.23. 01:30 | 17 |
| 2022.07.23. 01:45 | 17 |
| 2022.07.23. 02:00 | 17 |
| 2022.07.23. 02:15 | 17 |
| 2022.07.23. 02:30 | 17 |
| 2022.07.23. 02:45 | 17 |
| 2022.07.23. 03:00 | 17 |
| 2022.07.23. 03:15 | 17 |
| 2022.07.23. 03:30 | 17 |
| 2022.07.23. 03:45 | 17 |
| 2022.07.23. 04:00 | 17 |
| 2022.07.23. 04:15 | 17 |
| 2022.07.23. 04:30 | 17 |
| 2022.07.23. 04:45 | 17 |
| 2022.07.23. 05:00 | 17 |
| 2022.07.23. 05:15 | 17 |
| 2022.07.23. 05:30 | 17 |
| 2022.07.23. 05:45 | 17 |
| 2022.07.23. 06:00 | 17 |
| 2022.07.23. 06:15 | 17 |
| 2022.07.23. 06:30 | 17 |
| 2022.07.23. 06:45 | 17 |
| 2022.07.23. 07:00 | 17 |
| 2022.07.23. 07:15 | 17 |
| 2022.07.23. 07:30 | 17 |
| 2022.07.23. 07:45 | 17 |
| 2022.07.23. 08:00 | 17 |
| 2022.07.23. 08:15 | 17 |
| 2022.07.23. 08:30 | 17 |
| 2022.07.23. 08:45 | 17 |
| 2022.07.23. 09:00 | 17 |
| 2022.07.23. 09:15 | 17 |
| 2022.07.23. 09:30 | 17 |
| 2022.07.23. 09:45 | 17 |
| 2022.07.23. 10:00 | 17 |
| 2022.07.23. 10:15 | 17 |
| 2022.07.23. 10:30 | 17 |
| 2022.07.23. 10:45 | 17 |
| 2022.07.23. 11:00 | 17 |
| 2022.07.23. 11:15 | 17 |
| 2022.07.23. 11:30 | 17 |
| 2022.07.23. 11:45 | 17 |
| 2022.07.23. 12:00 | 17 |
| 2022.07.23. 12:15 | 17 |
| 2022.07.23. 12:30 | 17 |
| 2022.07.23. 12:45 | 17 |
| 2022.07.23. 13:00 | 17 |
| 2022.07.23. 13:15 | 17 |
| 2022.07.23. 13:30 | 17 |
| 2022.07.23. 13:45 | 17 |
| 2022.07.23. 14:00 | 17 |
| 2022.07.23. 14:15 | 17 |
| 2022.07.23. 14:30 | 17 |
| 2022.07.23. 14:45 | 17 |
| 2022.07.23. 15:00 | 17 |
| 2022.07.23. 15:15 | 17 |
| 2022.07.23. 15:30 | 17 |
| 2022.07.23. 15:45 | 17 |
| 2022.07.23. 16:00 | 17 |
| 2022.07.23. 16:15 | 17 |
| 2022.07.23. 16:30 | 17 |
| 2022.07.23. 16:45 | 17 |
| 2022.07.23. 17:00 | 17 |
| 2022.07.23. 17:15 | 17 |
| 2022.07.23. 17:30 | 17 |
| 2022.07.23. 17:45 | 17 |
| 2022.07.23. 18:00 | 17 |
| 2022.07.23. 18:15 | 17 |
| 2022.07.23. 18:30 | 17 |
| 2022.07.23. 18:45 | 17 |
| 2022.07.23. 19:00 | 17 |
| 2022.07.23. 19:15 | 17 |
| 2022.07.23. 19:30 | 17 |
| 2022.07.23. 19:45 | 17 |
| 2022.07.23. 20:00 | 17 |
| 2022.07.23. 20:15 | 17 |
| 2022.07.23. 20:30 | 17 |
| 2022.07.23. 20:45 | 17 |
| 2022.07.23. 21:00 | 17 |
| 2022.07.23. 21:15 | 17 |
| 2022.07.23. 21:30 | 17 |
| 2022.07.23. 21:45 | 17 |
| 2022.07.23. 22:00 | 17 |
| 2022.07.23. 22:15 | 17 |
| 2022.07.23. 22:30 | 17 |
| 2022.07.23. 22:45 | 17 |
| 2022.07.23. 23:00 | 17 |
| 2022.07.23. 23:15 | 17 |
| 2022.07.23. 23:30 | 17 |
| 2022.07.23. 23:45 | 17 |
| 2022.07.24. 00:00 | 17 |
| 2022.07.24. 00:15 | 17 |
| 2022.07.24. 00:30 | 17 |
| 2022.07.24. 00:45 | 17 |
| 2022.07.24. 01:00 | 17 |
| 2022.07.24. 01:15 | 17 |
| 2022.07.24. 01:30 | 17 |
| 2022.07.24. 01:45 | 17 |
| 2022.07.24. 02:00 | 17 |
| 2022.07.24. 02:15 | 17 |
| 2022.07.24. 02:30 | 17 |
| 2022.07.24. 02:45 | 17 |
| 2022.07.24. 03:00 | 17 |
| 2022.07.24. 03:15 | 17 |
| 2022.07.24. 03:30 | 17 |
| 2022.07.24. 03:45 | 17 |
| 2022.07.24. 04:00 | 17 |
| 2022.07.24. 04:15 | 17 |
| 2022.07.24. 04:30 | 17 |
| 2022.07.24. 04:45 | 17 |
| 2022.07.24. 05:00 | 17 |
| 2022.07.24. 05:15 | 17 |
| 2022.07.24. 05:30 | 17 |
| 2022.07.24. 05:45 | 17 |
| 2022.07.24. 06:00 | 17 |
| 2022.07.24. 06:15 | 17 |
| 2022.07.24. 06:30 | 17 |
| 2022.07.24. 06:45 | 17 |
| 2022.07.24. 07:00 | 17 |
| 2022.07.24. 07:15 | 17 |
| 2022.07.24. 07:30 | 17 |
| 2022.07.24. 07:45 | 17 |
| 2022.07.24. 08:00 | 17 |
| 2022.07.24. 08:15 | 17 |
| 2022.07.24. 08:30 | 17 |
| 2022.07.24. 08:45 | 17 |
| 2022.07.24. 09:00 | 17 |
| 2022.07.24. 09:15 | 17 |
| 2022.07.24. 09:30 | 17 |
| 2022.07.24. 09:45 | 17 |
| 2022.07.24. 10:00 | 17 |
| 2022.07.24. 10:15 | 17 |
| 2022.07.24. 10:30 | 17 |
| 2022.07.24. 10:45 | 17 |
| 2022.07.24. 11:00 | 17 |
| 2022.07.24. 11:15 | 17 |
| 2022.07.24. 11:30 | 17 |
| 2022.07.24. 11:45 | 17 |
| 2022.07.24. 12:00 | 17 |
| 2022.07.24. 12:15 | 17 |
| 2022.07.24. 12:30 | 17 |
| 2022.07.24. 12:45 | 17 |
| 2022.07.24. 13:00 | 17 |
| 2022.07.24. 13:15 | 17 |
| 2022.07.24. 13:30 | 17 |
| 2022.07.24. 13:45 | 17 |
| 2022.07.24. 14:00 | 17 |
| 2022.07.24. 14:15 | 17 |
| 2022.07.24. 14:30 | 17 |
| 2022.07.24. 14:45 | 17 |
| 2022.07.24. 15:00 | 17 |
| 2022.07.24. 15:15 | 17 |
| 2022.07.24. 15:30 | 17 |
| 2022.07.24. 15:45 | 17 |
| 2022.07.24. 16:00 | 17 |
| 2022.07.24. 16:15 | 17 |
| 2022.07.24. 16:30 | 17 |
| 2022.07.24. 16:45 | 17 |
| 2022.07.24. 17:00 | 17 |
| 2022.07.24. 17:15 | 17 |
| 2022.07.24. 17:30 | 17 |
| 2022.07.24. 17:45 | 17 |
| 2022.07.24. 18:00 | 17 |
| 2022.07.24. 18:15 | 17 |
| 2022.07.24. 18:30 | 17 |
| 2022.07.24. 18:45 | 17 |
| 2022.07.24. 19:00 | 17 |
| 2022.07.24. 19:15 | 17 |
| 2022.07.24. 19:30 | 17 |
| 2022.07.24. 19:45 | 17 |
| 2022.07.24. 20:00 | 17 |
| 2022.07.24. 20:15 | 17 |
| 2022.07.24. 20:30 | 17 |
| 2022.07.24. 20:45 | 17 |
| 2022.07.24. 21:00 | 17 |
| 2022.07.24. 21:15 | 17 |
| 2022.07.24. 21:30 | 17 |
| 2022.07.24. 21:45 | 17 |
| 2022.07.24. 22:00 | 17 |
| 2022.07.24. 22:15 | 17 |
| 2022.07.24. 22:30 | 17 |
| 2022.07.24. 22:45 | 17 |
| 2022.07.24. 23:00 | 17 |
| 2022.07.24. 23:15 | 17 |
| 2022.07.24. 23:30 | 17 |
| 2022.07.24. 23:45 | 17 |
| 2022.07.25. 00:00 | 17 |
| 2022.07.25. 00:15 | 17 |
| 2022.07.25. 00:30 | 17 |
| 2022.07.25. 00:45 | 17 |
| 2022.07.25. 01:00 | 17 |
| 2022.07.25. 01:15 | 17 |
| 2022.07.25. 01:30 | 17 |
| 2022.07.25. 01:45 | 17 |
| 2022.07.25. 02:00 | 17 |
| 2022.07.25. 02:15 | 17 |
| 2022.07.25. 02:30 | 17 |
| 2022.07.25. 02:45 | 17 |
| 2022.07.25. 03:00 | 17 |
| 2022.07.25. 03:15 | 17 |
| 2022.07.25. 03:30 | 17 |
| 2022.07.25. 03:45 | 17 |
| 2022.07.25. 04:00 | 17 |
| 2022.07.25. 04:15 | 17 |
| 2022.07.25. 04:30 | 17 |
| 2022.07.25. 04:45 | 17 |
| 2022.07.25. 05:00 | 17 |
| 2022.07.25. 05:15 | 17 |
| 2022.07.25. 05:30 | 17 |
| 2022.07.25. 05:45 | 17 |
| 2022.07.25. 06:00 | 17 |
| 2022.07.25. 06:15 | 17 |
| 2022.07.25. 06:30 | 17 |
| 2022.07.25. 06:45 | 17 |
| 2022.07.25. 07:00 | 17 |
| 2022.07.25. 07:15 | 17 |
| 2022.07.25. 07:30 | 17 |
| 2022.07.25. 07:45 | 17 |
| 2022.07.25. 08:00 | 17 |
| 2022.07.25. 08:15 | 17 |
| 2022.07.25. 08:30 | 17 |
| 2022.07.25. 08:45 | 17 |
| 2022.07.25. 09:00 | 17 |
| 2022.07.25. 09:15 | 17 |
| 2022.07.25. 09:30 | 17 |
| 2022.07.25. 09:45 | 17 |
| 2022.07.25. 10:00 | 17 |
| 2022.07.25. 10:15 | 17 |
| 2022.07.25. 10:30 | 17 |
| 2022.07.25. 10:45 | 17 |
| 2022.07.25. 11:00 | 17 |
| 2022.07.25. 11:15 | 17 |
| 2022.07.25. 11:30 | 17 |
| 2022.07.25. 11:45 | 17 |
| 2022.07.25. 12:00 | 17 |
| 2022.07.25. 12:15 | 17 |
| 2022.07.25. 12:30 | 17 |
| 2022.07.25. 12:45 | 17 |
| 2022.07.25. 13:00 | 17 |
| 2022.07.25. 13:15 | 17 |
| 2022.07.25. 13:30 | 17 |
| 2022.07.25. 13:45 | 17 |
| 2022.07.25. 14:00 | 17 |
| 2022.07.25. 14:15 | 17 |
| 2022.07.25. 14:30 | 17 |
| 2022.07.25. 14:45 | 17 |
| 2022.07.25. 15:00 | 17 |
| 2022.07.25. 15:15 | 17 |
| 2022.07.25. 15:30 | 17 |
| 2022.07.25. 15:45 | 17 |
| 2022.07.25. 16:00 | 17 |
| 2022.07.25. 16:15 | 17 |
| 2022.07.25. 16:30 | 17 |
| 2022.07.25. 16:45 | 17 |
| 2022.07.25. 17:00 | 17 |
| 2022.07.25. 17:15 | 17 |
| 2022.07.25. 17:30 | 17 |
| 2022.07.25. 17:45 | 17 |
| 2022.07.25. 18:00 | 17 |
| 2022.07.25. 18:15 | 17 |
| 2022.07.25. 18:30 | 17 |
| 2022.07.25. 18:45 | 17 |
| 2022.07.25. 19:00 | 17 |
| 2022.07.25. 19:15 | 17 |
| 2022.07.25. 19:30 | 17 |
| 2022.07.25. 19:45 | 17 |
| 2022.07.25. 20:00 | 17 |
| 2022.07.25. 20:15 | 17 |
| 2022.07.25. 20:30 | 17 |
| 2022.07.25. 20:45 | 17 |
| 2022.07.25. 21:00 | 17 |
| 2022.07.25. 21:15 | 17 |
| 2022.07.25. 21:30 | 17 |
| 2022.07.25. 21:45 | 17 |
| 2022.07.25. 22:00 | 17 |
| 2022.07.25. 22:15 | 17 |
| 2022.07.25. 22:30 | 17 |
| 2022.07.25. 22:45 | 17 |
| 2022.07.25. 23:00 | 17 |
| 2022.07.25. 23:15 | 17 |
| 2022.07.25. 23:30 | 17 |
| 2022.07.25. 23:45 | 17 |
| 2022.07.26. 00:00 | 17 |
| 2022.07.26. 00:15 | 17 |
| 2022.07.26. 00:30 | 17 |
| 2022.07.26. 00:45 | 17 |
| 2022.07.26. 01:00 | 17 |
| 2022.07.26. 01:15 | 17 |
| 2022.07.26. 01:30 | 17 |
| 2022.07.26. 01:45 | 17 |
| 2022.07.26. 02:00 | 17 |
| 2022.07.26. 02:15 | 17 |
| 2022.07.26. 02:30 | 17 |
| 2022.07.26. 02:45 | 17 |
| 2022.07.26. 03:00 | 17 |
| 2022.07.26. 03:15 | 17 |
| 2022.07.26. 03:30 | 17 |
| 2022.07.26. 03:45 | 17 |
| 2022.07.26. 04:00 | 17 |
| 2022.07.26. 04:15 | 17 |
| 2022.07.26. 04:30 | 17 |
| 2022.07.26. 04:45 | 17 |
| 2022.07.26. 05:00 | 17 |
| 2022.07.26. 05:15 | 17 |
| 2022.07.26. 05:30 | 17 |
| 2022.07.26. 05:45 | 17 |
| 2022.07.26. 06:00 | 17 |
| 2022.07.26. 06:15 | 17 |
| 2022.07.26. 06:30 | 17 |
| 2022.07.26. 06:45 | 17 |
| 2022.07.26. 07:00 | 17 |
| 2022.07.26. 07:15 | 17 |
| 2022.07.26. 07:30 | 17 |
| 2022.07.26. 07:45 | 17 |
| 2022.07.26. 08:00 | 17 |
| 2022.07.26. 08:15 | 17 |
| 2022.07.26. 08:30 | 17 |
| 2022.07.26. 08:45 | 17 |
| 2022.07.26. 09:00 | 17 |
| 2022.07.26. 09:15 | 17 |
| 2022.07.26. 09:30 | 17 |
| 2022.07.26. 09:45 | 17 |
| 2022.07.26. 10:00 | 17 |
| 2022.07.26. 10:15 | 17 |
| 2022.07.26. 10:30 | 17 |
| 2022.07.26. 10:45 | 17 |
| 2022.07.26. 11:00 | 17 |
| 2022.07.26. 11:15 | 17 |
| 2022.07.26. 11:30 | 17 |
| 2022.07.26. 11:45 | 17 |
| 2022.07.26. 12:00 | 17 |
| 2022.07.26. 12:15 | 17 |
| 2022.07.26. 12:30 | 17 |
| 2022.07.26. 12:45 | 17 |
| 2022.07.26. 13:00 | 17 |
| 2022.07.26. 13:15 | 17 |
| 2022.07.26. 13:30 | 17 |
| 2022.07.26. 13:45 | 17 |
| 2022.07.26. 14:00 | 17 |
| 2022.07.26. 14:15 | 17 |
| 2022.07.26. 14:30 | 17 |
| 2022.07.26. 14:45 | 17 |
| 2022.07.26. 15:00 | 17 |
| 2022.07.26. 15:15 | 17 |
| 2022.07.26. 15:30 | 17 |
| 2022.07.26. 15:45 | 17 |
| 2022.07.26. 16:00 | 17 |
| 2022.07.26. 16:15 | 17 |
| 2022.07.26. 16:30 | 17 |
| 2022.07.26. 16:45 | 17 |
| 2022.07.26. 17:00 | 17 |
| 2022.07.26. 17:15 | 17 |
| 2022.07.26. 17:30 | 17 |
| 2022.07.26. 17:45 | 17 |
| 2022.07.26. 18:00 | 17 |
| 2022.07.26. 18:15 | 17 |
| 2022.07.26. 18:30 | 17 |
| 2022.07.26. 18:45 | 17 |
| 2022.07.26. 19:00 | 17 |
| 2022.07.26. 19:15 | 17 |
| 2022.07.26. 19:30 | 17 |
| 2022.07.26. 19:45 | 17 |
| 2022.07.26. 20:00 | 17 |
| 2022.07.26. 20:15 | 17 |
| 2022.07.26. 20:30 | 17 |
| 2022.07.26. 20:45 | 17 |
| 2022.07.26. 21:00 | 17 |
| 2022.07.26. 21:15 | 17 |
| 2022.07.26. 21:30 | 17 |
| 2022.07.26. 21:45 | 17 |
| 2022.07.26. 22:00 | 17 |
| 2022.07.26. 22:15 | 17 |
| 2022.07.26. 22:30 | 17 |
| 2022.07.26. 22:45 | 17 |
| 2022.07.26. 23:00 | 17 |
| 2022.07.26. 23:15 | 17 |
| 2022.07.26. 23:30 | 17 |
| 2022.07.26. 23:45 | 17 |
| 2022.07.27. 00:00 | 17 |
| 2022.07.27. 00:15 | 17 |
| 2022.07.27. 00:30 | 17 |
| 2022.07.27. 00:45 | 17 |
| 2022.07.27. 01:00 | 17 |
| 2022.07.27. 01:15 | 17 |
| 2022.07.27. 01:30 | 17 |
| 2022.07.27. 01:45 | 17 |
| 2022.07.27. 02:00 | 17 |
| 2022.07.27. 02:15 | 17 |
| 2022.07.27. 02:30 | 17 |
| 2022.07.27. 02:45 | 17 |
| 2022.07.27. 03:00 | 17 |
| 2022.07.27. 03:15 | 17 |
| 2022.07.27. 03:30 | 17 |
| 2022.07.27. 03:45 | 17 |
| 2022.07.27. 04:00 | 17 |
| 2022.07.27. 04:15 | 17 |
| 2022.07.27. 04:30 | 17 |
| 2022.07.27. 04:45 | 17 |
| 2022.07.27. 05:00 | 17 |
| 2022.07.27. 05:15 | 17 |
| 2022.07.27. 05:30 | 17 |
| 2022.07.27. 05:45 | 17 |
| 2022.07.27. 06:00 | 17 |
| 2022.07.27. 06:15 | 17 |
| 2022.07.27. 06:30 | 17 |
| 2022.07.27. 06:45 | 17 |
| 2022.07.27. 07:00 | 17 |
| 2022.07.27. 07:15 | 17 |
| 2022.07.27. 07:30 | 17 |
| 2022.07.27. 07:45 | 17 |
| 2022.07.27. 08:00 | 17 |
| 2022.07.27. 08:15 | 17 |
| 2022.07.27. 08:30 | 17 |
| 2022.07.27. 08:45 | 17 |
| 2022.07.27. 09:00 | 17 |
| 2022.07.27. 09:15 | 17 |
| 2022.07.27. 09:30 | 17 |
| 2022.07.27. 09:45 | 17 |
| 2022.07.27. 10:00 | 17 |
| 2022.07.27. 10:15 | 17 |
| 2022.07.27. 10:30 | 17 |
| 2022.07.27. 10:45 | 17 |
| 2022.07.27. 11:00 | 17 |
| 2022.07.27. 11:15 | 17 |
| 2022.07.27. 11:30 | 17 |
| 2022.07.27. 11:45 | 17 |
| 2022.07.27. 12:00 | 17 |
| 2022.07.27. 12:15 | 17 |
| 2022.07.27. 12:30 | 17 |
| 2022.07.27. 12:45 | 17 |
| 2022.07.27. 13:00 | 17 |
| 2022.07.27. 13:15 | 17 |
| 2022.07.27. 13:30 | 17 |
| 2022.07.27. 13:45 | 17 |
| 2022.07.27. 14:00 | 17 |
| 2022.07.27. 14:15 | 17 |
| 2022.07.27. 14:30 | 17 |
| 2022.07.27. 14:45 | 17 |
| 2022.07.27. 15:00 | 17 |
| 2022.07.27. 15:15 | 17 |
| 2022.07.27. 15:30 | 17 |
| 2022.07.27. 15:45 | 17 |
| 2022.07.27. 16:00 | 17 |
| 2022.07.27. 16:15 | 17 |
| 2022.07.27. 16:30 | 17 |
| 2022.07.27. 16:45 | 17 |
| 2022.07.27. 17:00 | 17 |
| 2022.07.27. 17:15 | 17 |
| 2022.07.27. 17:30 | 17 |
| 2022.07.27. 17:45 | 17 |
| 2022.07.27. 18:00 | 17 |
| 2022.07.27. 18:15 | 17 |
| 2022.07.27. 18:30 | 17 |
| 2022.07.27. 18:45 | 17 |
| 2022.07.27. 19:00 | 17 |
| 2022.07.27. 19:15 | 17 |
| 2022.07.27. 19:30 | 17 |
| 2022.07.27. 19:45 | 17 |
| 2022.07.27. 20:00 | 17 |
| 2022.07.27. 20:15 | 17 |
| 2022.07.27. 20:30 | 17 |
| 2022.07.27. 20:45 | 17 |
| 2022.07.27. 21:00 | 17 |
| 2022.07.27. 21:15 | 17 |
| 2022.07.27. 21:30 | 17 |
| 2022.07.27. 21:45 | 17 |
| 2022.07.27. 22:00 | 17 |
| 2022.07.27. 22:15 | 17 |
| 2022.07.27. 22:30 | 17 |
| 2022.07.27. 22:45 | 17 |
| 2022.07.27. 23:00 | 17 |
| 2022.07.27. 23:15 | 17 |
| 2022.07.27. 23:30 | 17 |
| 2022.07.27. 23:45 | 17 |
| 2022.07.28. 00:00 | 17 |
| 2022.07.28. 00:15 | 17 |
| 2022.07.28. 00:30 | 17 |
| 2022.07.28. 00:45 | 17 |
| 2022.07.28. 01:00 | 17 |
| 2022.07.28. 01:15 | 17 |
| 2022.07.28. 01:30 | 17 |
| 2022.07.28. 01:45 | 17 |
| 2022.07.28. 02:00 | 17 |
| 2022.07.28. 02:15 | 17 |
| 2022.07.28. 02:30 | 17 |
| 2022.07.28. 02:45 | 17 |
| 2022.07.28. 03:00 | 17 |
| 2022.07.28. 03:15 | 17 |
| 2022.07.28. 03:30 | 17 |
| 2022.07.28. 03:45 | 17 |
| 2022.07.28. 04:00 | 17 |
| 2022.07.28. 04:15 | 17 |
| 2022.07.28. 04:30 | 17 |
| 2022.07.28. 04:45 | 17 |
| 2022.07.28. 05:00 | 17 |
| 2022.07.28. 05:15 | 17 |
| 2022.07.28. 05:30 | 17 |
| 2022.07.28. 05:45 | 17 |
| 2022.07.28. 06:00 | 17 |
| 2022.07.28. 06:15 | 17 |
| 2022.07.28. 06:30 | 17 |
| 2022.07.28. 06:45 | 17 |
| 2022.07.28. 07:00 | 17 |
| 2022.07.28. 07:15 | 17 |
| 2022.07.28. 07:30 | 17 |
| 2022.07.28. 07:45 | 17 |
| 2022.07.28. 08:00 | 17 |
| 2022.07.28. 08:15 | 17 |
| 2022.07.28. 08:30 | 17 |
| 2022.07.28. 08:45 | 17 |
| 2022.07.28. 09:00 | 17 |
| 2022.07.28. 09:15 | 17 |
| 2022.07.28. 09:30 | 17 |
| 2022.07.28. 09:45 | 17 |
| 2022.07.28. 10:00 | 17 |
| 2022.07.28. 10:15 | 17 |
| 2022.07.28. 10:30 | 17 |
| 2022.07.28. 10:45 | 17 |
| 2022.07.28. 11:00 | 17 |
| 2022.07.28. 11:15 | 17 |
| 2022.07.28. 11:30 | 17 |
| 2022.07.28. 11:45 | 17 |
| 2022.07.28. 12:00 | 17 |
| 2022.07.28. 12:15 | 17 |
| 2022.07.28. 12:30 | 17 |
| 2022.07.28. 12:45 | 17 |
| 2022.07.28. 13:00 | 17 |
| 2022.07.28. 13:15 | 17 |
| 2022.07.28. 13:30 | 17 |
| 2022.07.28. 13:45 | 17 |
| 2022.07.28. 14:00 | 17 |
| 2022.07.28. 14:15 | 17 |
| 2022.07.28. 14:30 | 17 |
| 2022.07.28. 14:45 | 17 |
| 2022.07.28. 15:00 | 17 |
| 2022.07.28. 15:15 | 17 |
| 2022.07.28. 15:30 | 17 |
| 2022.07.28. 15:45 | 17 |
| 2022.07.28. 16:00 | 17 |
| 2022.07.28. 16:15 | 17 |
| 2022.07.28. 16:30 | 17 |
| 2022.07.28. 16:45 | 17 |
| 2022.07.28. 17:00 | 17 |
| 2022.07.28. 17:15 | 17 |
| 2022.07.28. 17:30 | 17 |
| 2022.07.28. 17:45 | 17 |
| 2022.07.28. 18:00 | 17 |
| 2022.07.28. 18:15 | 17 |
| 2022.07.28. 18:30 | 17 |
| 2022.07.28. 18:45 | 17 |
| 2022.07.28. 19:00 | 17 |
| 2022.07.28. 19:15 | 17 |
| 2022.07.28. 19:30 | 17 |
| 2022.07.28. 19:45 | 17 |
| 2022.07.28. 20:00 | 17 |
| 2022.07.28. 20:15 | 17 |
| 2022.07.28. 20:30 | 17 |
| 2022.07.28. 20:45 | 17 |
| 2022.07.28. 21:00 | 17 |
| 2022.07.28. 21:15 | 17 |
| 2022.07.28. 21:30 | 17 |
| 2022.07.28. 21:45 | 17 |
| 2022.07.28. 22:00 | 17 |
| 2022.07.28. 22:15 | 17 |
| 2022.07.28. 22:30 | 17 |
| 2022.07.28. 22:45 | 17 |
| 2022.07.28. 23:00 | 17 |
| 2022.07.28. 23:15 | 17 |
| 2022.07.28. 23:30 | 17 |
| 2022.07.28. 23:45 | 17 |
| 2022.07.29. 00:00 | 17 |
| 2022.07.29. 00:15 | 17 |
| 2022.07.29. 00:30 | 17 |
| 2022.07.29. 00:45 | 17 |
| 2022.07.29. 01:00 | 17 |
| 2022.07.29. 01:15 | 17 |
| 2022.07.29. 01:30 | 17 |
| 2022.07.29. 01:45 | 17 |
| 2022.07.29. 02:00 | 17 |
| 2022.07.29. 02:15 | 17 |
| 2022.07.29. 02:30 | 17 |
| 2022.07.29. 02:45 | 17 |
| 2022.07.29. 03:00 | 17 |
| 2022.07.29. 03:15 | 17 |
| 2022.07.29. 03:30 | 17 |
| 2022.07.29. 03:45 | 17 |
| 2022.07.29. 04:00 | 17 |
| 2022.07.29. 04:15 | 17 |
| 2022.07.29. 04:30 | 17 |
| 2022.07.29. 04:45 | 17 |
| 2022.07.29. 05:00 | 17 |
| 2022.07.29. 05:15 | 17 |
| 2022.07.29. 05:30 | 17 |
| 2022.07.29. 05:45 | 17 |
| 2022.07.29. 06:00 | 17 |
| 2022.07.29. 06:15 | 17 |
| 2022.07.29. 06:30 | 17 |
| 2022.07.29. 06:45 | 17 |
| 2022.07.29. 07:00 | 17 |
| 2022.07.29. 07:15 | 17 |
| 2022.07.29. 07:30 | 17 |
| 2022.07.29. 07:45 | 17 |
| 2022.07.29. 08:00 | 17 |
| 2022.07.29. 08:15 | 17 |
| 2022.07.29. 08:30 | 17 |
| 2022.07.29. 08:45 | 17 |
| 2022.07.29. 09:00 | 17 |
| 2022.07.29. 09:15 | 17 |
| 2022.07.29. 09:30 | 17 |
| 2022.07.29. 09:45 | 17 |
| 2022.07.29. 10:00 | 17 |
| 2022.07.29. 10:15 | 17 |
| 2022.07.29. 10:30 | 17 |
| 2022.07.29. 10:45 | 17 |
| 2022.07.29. 11:00 | 17 |
| 2022.07.29. 11:15 | 17 |
| 2022.07.29. 11:30 | 17 |
| 2022.07.29. 11:45 | 17 |
| 2022.07.29. 12:00 | 17 |
| 2022.07.29. 12:15 | 17 |
| 2022.07.29. 12:30 | 17 |
| 2022.07.29. 12:45 | 17 |
| 2022.07.29. 13:00 | 17 |
| 2022.07.29. 13:15 | 17 |
| 2022.07.29. 13:30 | 17 |
| 2022.07.29. 13:45 | 17 |
| 2022.07.29. 14:00 | 17 |
| 2022.07.29. 14:15 | 17 |
| 2022.07.29. 14:30 | 17 |
| 2022.07.29. 14:45 | 17 |
| 2022.07.29. 15:00 | 17 |
| 2022.07.29. 15:15 | 17 |
| 2022.07.29. 15:30 | 17 |
| 2022.07.29. 15:45 | 17 |
| 2022.07.29. 16:00 | 17 |
| 2022.07.29. 16:15 | 17 |
| 2022.07.29. 16:30 | 17 |
| 2022.07.29. 16:45 | 17 |
| 2022.07.29. 17:00 | 17 |
| 2022.07.29. 17:15 | 17 |
| 2022.07.29. 17:30 | 17 |
| 2022.07.29. 17:45 | 17 |
| 2022.07.29. 18:00 | 17 |
| 2022.07.29. 18:15 | 17 |
| 2022.07.29. 18:30 | 17 |
| 2022.07.29. 18:45 | 17 |
| 2022.07.29. 19:00 | 17 |
| 2022.07.29. 19:15 | 17 |
| 2022.07.29. 19:30 | 17 |
| 2022.07.29. 19:45 | 17 |
| 2022.07.29. 20:00 | 17 |
| 2022.07.29. 20:15 | 17 |
| 2022.07.29. 20:30 | 17 |
| 2022.07.29. 20:45 | 17 |
| 2022.07.29. 21:00 | 17 |
| 2022.07.29. 21:15 | 17 |
| 2022.07.29. 21:30 | 17 |
| 2022.07.29. 21:45 | 17 |
| 2022.07.29. 22:00 | 17 |
| 2022.07.29. 22:15 | 17 |
| 2022.07.29. 22:30 | 17 |
| 2022.07.29. 22:45 | 17 |
| 2022.07.29. 23:00 | 17 |
| 2022.07.29. 23:15 | 17 |
| 2022.07.29. 23:30 | 17 |
| 2022.07.29. 23:45 | 17 |
| 2022.07.30. 00:00 | 17 |
| 2022.07.30. 00:15 | 17 |
| 2022.07.30. 00:30 | 17 |
| 2022.07.30. 00:45 | 17 |
| 2022.07.30. 01:00 | 17 |
| 2022.07.30. 01:15 | 17 |
| 2022.07.30. 01:30 | 17 |
| 2022.07.30. 01:45 | 17 |
| 2022.07.30. 02:00 | 17 |
| 2022.07.30. 02:15 | 17 |
| 2022.07.30. 02:30 | 17 |
| 2022.07.30. 02:45 | 17 |
| 2022.07.30. 03:00 | 17 |
| 2022.07.30. 03:15 | 17 |
| 2022.07.30. 03:30 | 17 |
| 2022.07.30. 03:45 | 17 |
| 2022.07.30. 04:00 | 17 |
| 2022.07.30. 04:15 | 17 |
| 2022.07.30. 04:30 | 17 |
| 2022.07.30. 04:45 | 17 |
| 2022.07.30. 05:00 | 17 |
| 2022.07.30. 05:15 | 17 |
| 2022.07.30. 05:30 | 17 |
| 2022.07.30. 05:45 | 17 |
| 2022.07.30. 06:00 | 17 |
| 2022.07.30. 06:15 | 17 |
| 2022.07.30. 06:30 | 17 |
| 2022.07.30. 06:45 | 17 |
| 2022.07.30. 07:00 | 17 |
| 2022.07.30. 07:15 | 17 |
| 2022.07.30. 07:30 | 17 |
| 2022.07.30. 07:45 | 17 |
| 2022.07.30. 08:00 | 17 |
| 2022.07.30. 08:15 | 17 |
| 2022.07.30. 08:30 | 17 |
| 2022.07.30. 08:45 | 17 |
| 2022.07.30. 09:00 | 17 |
| 2022.07.30. 09:15 | 17 |
| 2022.07.30. 09:30 | 17 |
| 2022.07.30. 09:45 | 17 |
| 2022.07.30. 10:00 | 17 |
| 2022.07.30. 10:15 | 17 |
| 2022.07.30. 10:30 | 17 |
| 2022.07.30. 10:45 | 17 |
| 2022.07.30. 11:00 | 17 |
| 2022.07.30. 11:15 | 17 |
| 2022.07.30. 11:30 | 17 |
| 2022.07.30. 11:45 | 17 |
| 2022.07.30. 12:00 | 17 |
| 2022.07.30. 12:15 | 17 |
| 2022.07.30. 12:30 | 17 |
| 2022.07.30. 12:45 | 17 |
| 2022.07.30. 13:00 | 17 |
| 2022.07.30. 13:15 | 17 |
| 2022.07.30. 13:30 | 17 |
| 2022.07.30. 13:45 | 17 |
| 2022.07.30. 14:00 | 17 |
| 2022.07.30. 14:15 | 17 |
| 2022.07.30. 14:30 | 17 |
| 2022.07.30. 14:45 | 17 |
| 2022.07.30. 15:00 | 17 |
| 2022.07.30. 15:15 | 17 |
| 2022.07.30. 15:30 | 17 |
| 2022.07.30. 15:45 | 17 |
| 2022.07.30. 16:00 | 17 |
| 2022.07.30. 16:15 | 17 |
| 2022.07.30. 16:30 | 17 |
| 2022.07.30. 16:45 | 17 |
| 2022.07.30. 17:00 | 17 |
| 2022.07.30. 17:15 | 17 |
| 2022.07.30. 17:30 | 17 |
| 2022.07.30. 17:45 | 17 |
| 2022.07.30. 18:00 | 17 |
| 2022.07.30. 18:15 | 17 |
| 2022.07.30. 18:30 | 17 |
| 2022.07.30. 18:45 | 17 |
| 2022.07.30. 19:00 | 17 |
| 2022.07.30. 19:15 | 17 |
| 2022.07.30. 19:30 | 17 |
| 2022.07.30. 19:45 | 17 |
| 2022.07.30. 20:00 | 17 |
| 2022.07.30. 20:15 | 17 |
| 2022.07.30. 20:30 | 17 |
| 2022.07.30. 20:45 | 17 |
| 2022.07.30. 21:00 | 17 |
| 2022.07.30. 21:15 | 17 |
| 2022.07.30. 21:30 | 17 |
| 2022.07.30. 21:45 | 17 |
| 2022.07.30. 22:00 | 17 |
| 2022.07.30. 22:15 | 17 |
| 2022.07.30. 22:30 | 17 |
| 2022.07.30. 22:45 | 17 |
| 2022.07.30. 23:00 | 17 |
| 2022.07.30. 23:15 | 17 |
| 2022.07.30. 23:30 | 17 |
| 2022.07.30. 23:45 | 17 |
| 2022.07.31. 00:00 | 17 |
| 2022.07.31. 00:15 | 17 |
| 2022.07.31. 00:30 | 17 |
| 2022.07.31. 00:45 | 17 |
| 2022.07.31. 01:00 | 17 |
| 2022.07.31. 01:15 | 17 |
| 2022.07.31. 01:30 | 17 |
| 2022.07.31. 01:45 | 17 |
| 2022.07.31. 02:00 | 17 |
| 2022.07.31. 02:15 | 17 |
| 2022.07.31. 02:30 | 17 |
| 2022.07.31. 02:45 | 17 |
| 2022.07.31. 03:00 | 17 |
| 2022.07.31. 03:15 | 17 |
| 2022.07.31. 03:30 | 17 |
| 2022.07.31. 03:45 | 17 |
| 2022.07.31. 04:00 | 17 |
| 2022.07.31. 04:15 | 17 |
| 2022.07.31. 04:30 | 17 |
| 2022.07.31. 04:45 | 17 |
| 2022.07.31. 05:00 | 17 |
| 2022.07.31. 05:15 | 17 |
| 2022.07.31. 05:30 | 17 |
| 2022.07.31. 05:45 | 17 |
| 2022.07.31. 06:00 | 17 |
| 2022.07.31. 06:15 | 17 |
| 2022.07.31. 06:30 | 17 |
| 2022.07.31. 06:45 | 17 |
| 2022.07.31. 07:00 | 17 |
| 2022.07.31. 07:15 | 17 |
| 2022.07.31. 07:30 | 17 |
| 2022.07.31. 07:45 | 17 |
| 2022.07.31. 08:00 | 17 |
| 2022.07.31. 08:15 | 17 |
| 2022.07.31. 08:30 | 17 |
| 2022.07.31. 08:45 | 17 |
| 2022.07.31. 09:00 | 17 |
| 2022.07.31. 09:15 | 17 |
| 2022.07.31. 09:30 | 17 |
| 2022.07.31. 09:45 | 17 |
| 2022.07.31. 10:00 | 17 |
| 2022.07.31. 10:15 | 17 |
| 2022.07.31. 10:30 | 17 |
| 2022.07.31. 10:45 | 17 |
| 2022.07.31. 11:00 | 17 |
| 2022.07.31. 11:15 | 17 |
| 2022.07.31. 11:30 | 17 |
| 2022.07.31. 11:45 | 17 |
| 2022.07.31. 12:00 | 17 |
| 2022.07.31. 12:15 | 17 |
| 2022.07.31. 12:30 | 17 |
| 2022.07.31. 12:45 | 17 |
| 2022.07.31. 13:00 | 17 |
| 2022.07.31. 13:15 | 17 |
| 2022.07.31. 13:30 | 17 |
| 2022.07.31. 13:45 | 17 |
| 2022.07.31. 14:00 | 17 |
| 2022.07.31. 14:15 | 17 |
| 2022.07.31. 14:30 | 17 |
| 2022.07.31. 14:45 | 17 |
| 2022.07.31. 15:00 | 17 |
| 2022.07.31. 15:15 | 17 |
| 2022.07.31. 15:30 | 17 |
| 2022.07.31. 15:45 | 17 |
| 2022.07.31. 16:00 | 17 |
| 2022.07.31. 16:15 | 17 |
| 2022.07.31. 16:30 | 17 |
| 2022.07.31. 16:45 | 17 |
| 2022.07.31. 17:00 | 17 |
| 2022.07.31. 17:15 | 17 |
| 2022.07.31. 17:30 | 17 |
| 2022.07.31. 17:45 | 17 |
| 2022.07.31. 18:00 | 17 |
| 2022.07.31. 18:15 | 17 |
| 2022.07.31. 18:30 | 17 |
| 2022.07.31. 18:45 | 17 |
| 2022.07.31. 19:00 | 17 |
| 2022.07.31. 19:15 | 17 |
| 2022.07.31. 19:30 | 17 |
| 2022.07.31. 19:45 | 17 |
| 2022.07.31. 20:00 | 17 |
| 2022.07.31. 20:15 | 17 |
| 2022.07.31. 20:30 | 17 |
| 2022.07.31. 20:45 | 17 |
| 2022.07.31. 21:00 | 17 |
| 2022.07.31. 21:15 | 17 |
| 2022.07.31. 21:30 | 17 |
| 2022.07.31. 21:45 | 17 |
| 2022.07.31. 22:00 | 17 |
| 2022.07.31. 22:15 | 17 |
| 2022.07.31. 22:30 | 17 |
| 2022.07.31. 22:45 | 17 |
| 2022.07.31. 23:00 | 17 |
| 2022.07.31. 23:15 | 17 |
| 2022.07.31. 23:30 | 17 |
| 2022.07.31. 23:45 | 17 |
| 2022.08.01. 00:00 | 17 |
| 2022.08.01. 00:15 | 17 |
| 2022.08.01. 00:30 | 17 |
| 2022.08.01. 00:45 | 17 |
| 2022.08.01. 01:00 | 17 |
| 2022.08.01. 01:15 | 17 |
| 2022.08.01. 01:30 | 17 |
| 2022.08.01. 01:45 | 17 |
| 2022.08.01. 02:00 | 17 |
| 2022.08.01. 02:15 | 17 |
| 2022.08.01. 02:30 | 17 |
| 2022.08.01. 02:45 | 17 |
| 2022.08.01. 03:00 | 17 |
| 2022.08.01. 03:15 | 17 |
| 2022.08.01. 03:30 | 17 |
| 2022.08.01. 03:45 | 17 |
| 2022.08.01. 04:00 | 17 |
| 2022.08.01. 04:15 | 17 |
| 2022.08.01. 04:30 | 17 |
| 2022.08.01. 04:45 | 17 |
| 2022.08.01. 05:00 | 17 |
| 2022.08.01. 05:15 | 17 |
| 2022.08.01. 05:30 | 17 |
| 2022.08.01. 05:45 | 17 |
| 2022.08.01. 06:00 | 17 |
| 2022.08.01. 06:15 | 17 |
| 2022.08.01. 06:30 | 17 |
| 2022.08.01. 06:45 | 17 |
| 2022.08.01. 07:00 | 17 |
| 2022.08.01. 07:15 | 17 |
| 2022.08.01. 07:30 | 17 |
| 2022.08.01. 07:45 | 17 |
| 2022.08.01. 08:00 | 17 |
| 2022.08.01. 08:15 | 17 |
| 2022.08.01. 08:30 | 17 |
| 2022.08.01. 08:45 | 17 |
| 2022.08.01. 09:00 | 17 |
| 2022.08.01. 09:15 | 17 |
| 2022.08.01. 09:30 | 17 |
| 2022.08.01. 09:45 | 17 |
| 2022.08.01. 10:00 | 17 |
| 2022.08.01. 10:15 | 17 |
| 2022.08.01. 10:30 | 17 |
| 2022.08.01. 10:45 | 17 |
| 2022.08.01. 11:00 | 17 |
| 2022.08.01. 11:15 | 17 |
| 2022.08.01. 11:30 | 17 |
| 2022.08.01. 11:45 | 17 |
| 2022.08.01. 12:00 | 17 |
| 2022.08.01. 12:15 | 17 |
| 2022.08.01. 12:30 | 17 |
| 2022.08.01. 12:45 | 17 |
| 2022.08.01. 13:00 | 17 |
| 2022.08.01. 13:15 | 17 |
| 2022.08.01. 13:30 | 17 |
| 2022.08.01. 13:45 | 17 |
| 2022.08.01. 14:00 | 17 |
| 2022.08.01. 14:15 | 17 |
| 2022.08.01. 14:30 | 17 |
| 2022.08.01. 14:45 | 17 |
| 2022.08.01. 15:00 | 17 |
| 2022.08.01. 15:15 | 17 |
| 2022.08.01. 15:30 | 17 |
| 2022.08.01. 15:45 | 17 |
| 2022.08.01. 16:00 | 17 |
| 2022.08.01. 16:15 | 17 |
| 2022.08.01. 16:30 | 17 |
| 2022.08.01. 16:45 | 17 |
| 2022.08.01. 17:00 | 17 |
| 2022.08.01. 17:15 | 17 |
| 2022.08.01. 17:30 | 17 |
| 2022.08.01. 17:45 | 17 |
| 2022.08.01. 18:00 | 17 |
| 2022.08.01. 18:15 | 17 |
| 2022.08.01. 18:30 | 17 |
| 2022.08.01. 18:45 | 17 |
| 2022.08.01. 19:00 | 17 |
| 2022.08.01. 19:15 | 17 |
| 2022.08.01. 19:30 | 17 |
| 2022.08.01. 19:45 | 17 |
| 2022.08.01. 20:00 | 17 |
| 2022.08.01. 20:15 | 17 |
| 2022.08.01. 20:30 | 17 |
| 2022.08.01. 20:45 | 17 |
| 2022.08.01. 21:00 | 17 |
| 2022.08.01. 21:15 | 17 |
| 2022.08.01. 21:30 | 17 |
| 2022.08.01. 21:45 | 17 |
| 2022.08.01. 22:00 | 17 |
| 2022.08.01. 22:15 | 17 |
| 2022.08.01. 22:30 | 17 |
| 2022.08.01. 22:45 | 17 |
| 2022.08.01. 23:00 | 17 |
| 2022.08.01. 23:15 | 17 |
| 2022.08.01. 23:30 | 17 |
| 2022.08.01. 23:45 | 17 |
| 2022.08.02. 00:00 | 17 |
| 2022.08.02. 00:15 | 17 |
| 2022.08.02. 00:30 | 17 |
| 2022.08.02. 00:45 | 17 |
| 2022.08.02. 01:00 | 17 |
| 2022.08.02. 01:15 | 17 |
| 2022.08.02. 01:30 | 17 |
| 2022.08.02. 01:45 | 17 |
| 2022.08.02. 02:00 | 17 |
| 2022.08.02. 02:15 | 17 |
| 2022.08.02. 02:30 | 17 |
| 2022.08.02. 02:45 | 17 |
| 2022.08.02. 03:00 | 17 |
| 2022.08.02. 03:15 | 17 |
| 2022.08.02. 03:30 | 17 |
| 2022.08.02. 03:45 | 17 |
| 2022.08.02. 04:00 | 17 |
| 2022.08.02. 04:15 | 17 |
| 2022.08.02. 04:30 | 17 |
| 2022.08.02. 04:45 | 17 |
| 2022.08.02. 05:00 | 17 |
| 2022.08.02. 05:15 | 17 |
| 2022.08.02. 05:30 | 17 |
| 2022.08.02. 05:45 | 17 |
| 2022.08.02. 06:00 | 17 |
| 2022.08.02. 06:15 | 17 |
| 2022.08.02. 06:30 | 17 |
| 2022.08.02. 06:45 | 17 |
| 2022.08.02. 07:00 | 17 |
| 2022.08.02. 07:15 | 17 |
| 2022.08.02. 07:30 | 17 |
| 2022.08.02. 07:45 | 17 |
| 2022.08.02. 08:00 | 17 |
| 2022.08.02. 08:15 | 17 |
| 2022.08.02. 08:30 | 17 |
| 2022.08.02. 08:45 | 17 |
| 2022.08.02. 09:00 | 17 |
| 2022.08.02. 09:15 | 17 |
| 2022.08.02. 09:30 | 17 |
| 2022.08.02. 09:45 | 17 |
| 2022.08.02. 10:00 | 17 |
| 2022.08.02. 10:15 | 17 |
| 2022.08.02. 10:30 | 17 |
| 2022.08.02. 10:45 | 17 |
| 2022.08.02. 11:00 | 17 |
| 2022.08.02. 11:15 | 17 |
| 2022.08.02. 11:30 | 17 |
| 2022.08.02. 11:45 | 17 |
| 2022.08.02. 12:00 | 17 |
| 2022.08.02. 12:15 | 17 |
| 2022.08.02. 12:30 | 17 |
| 2022.08.02. 12:45 | 17 |
| 2022.08.02. 13:00 | 17 |
| 2022.08.02. 13:15 | 17 |
| 2022.08.02. 13:30 | 17 |
| 2022.08.02. 13:45 | 17 |
| 2022.08.02. 14:00 | 17 |
| 2022.08.02. 14:15 | 17 |
| 2022.08.02. 14:30 | 17 |
| 2022.08.02. 14:45 | 17 |
| 2022.08.02. 15:00 | 17 |
| 2022.08.02. 15:15 | 17 |
| 2022.08.02. 15:30 | 17 |
| 2022.08.02. 15:45 | 17 |
| 2022.08.02. 16:00 | 17 |
| 2022.08.02. 16:15 | 17 |
| 2022.08.02. 16:30 | 17 |
| 2022.08.02. 16:45 | 17 |
| 2022.08.02. 17:00 | 17 |
| 2022.08.02. 17:15 | 17 |
| 2022.08.02. 17:30 | 17 |
| 2022.08.02. 17:45 | 17 |
| 2022.08.02. 18:00 | 17 |
| 2022.08.02. 18:15 | 17 |
| 2022.08.02. 18:30 | 17 |
| 2022.08.02. 18:45 | 17 |
| 2022.08.02. 19:00 | 17 |
| 2022.08.02. 19:15 | 17 |
| 2022.08.02. 19:30 | 17 |
| 2022.08.02. 19:45 | 17 |
| 2022.08.02. 20:00 | 17 |
| 2022.08.02. 20:15 | 17 |
| 2022.08.02. 20:30 | 17 |
| 2022.08.02. 20:45 | 17 |
| 2022.08.02. 21:00 | 17 |
| 2022.08.02. 21:15 | 17 |
| 2022.08.02. 21:30 | 17 |
| 2022.08.02. 21:45 | 17 |
| 2022.08.02. 22:00 | 17 |
| 2022.08.02. 22:15 | 17 |
| 2022.08.02. 22:30 | 17 |
| 2022.08.02. 22:45 | 17 |
| 2022.08.02. 23:00 | 17 |
| 2022.08.02. 23:15 | 17 |
| 2022.08.02. 23:30 | 17 |
| 2022.08.02. 23:45 | 17 |
| 2022.08.03. 00:00 | 17 |
| 2022.08.03. 00:15 | 17 |
| 2022.08.03. 00:30 | 17 |
| 2022.08.03. 00:45 | 17 |
| 2022.08.03. 01:00 | 17 |
| 2022.08.03. 01:15 | 17 |
| 2022.08.03. 01:30 | 17 |
| 2022.08.03. 01:45 | 17 |
| 2022.08.03. 02:00 | 17 |
| 2022.08.03. 02:15 | 17 |
| 2022.08.03. 02:30 | 17 |
| 2022.08.03. 02:45 | 17 |
| 2022.08.03. 03:00 | 17 |
| 2022.08.03. 03:15 | 17 |
| 2022.08.03. 03:30 | 17 |
| 2022.08.03. 03:45 | 17 |
| 2022.08.03. 04:00 | 17 |
| 2022.08.03. 04:15 | 17 |
| 2022.08.03. 04:30 | 17 |
| 2022.08.03. 04:45 | 17 |
| 2022.08.03. 05:00 | 17 |
| 2022.08.03. 05:15 | 17 |
| 2022.08.03. 05:30 | 17 |
| 2022.08.03. 05:45 | 17 |
| 2022.08.03. 06:00 | 17 |
| 2022.08.03. 06:15 | 17 |
| 2022.08.03. 06:30 | 17 |
| 2022.08.03. 06:45 | 17 |
| 2022.08.03. 07:00 | 17 |
| 2022.08.03. 07:15 | 17 |
| 2022.08.03. 07:30 | 17 |
| 2022.08.03. 07:45 | 17 |
| 2022.08.03. 08:00 | 17 |
| 2022.08.03. 08:15 | 17 |
| 2022.08.03. 08:30 | 17 |
| 2022.08.03. 08:45 | 17 |
| 2022.08.03. 09:00 | 17 |
| 2022.08.03. 09:15 | 17 |
| 2022.08.03. 09:30 | 17 |
| 2022.08.03. 09:45 | 17 |
| 2022.08.03. 10:00 | 17 |
| 2022.08.03. 10:15 | 17 |
| 2022.08.03. 10:30 | 17 |
| 2022.08.03. 10:45 | 17 |
| 2022.08.03. 11:00 | 17 |
| 2022.08.03. 11:15 | 17 |
| 2022.08.03. 11:30 | 17 |
| 2022.08.03. 11:45 | 17 |
| 2022.08.03. 12:00 | 17 |
| 2022.08.03. 12:15 | 17 |
| 2022.08.03. 12:30 | 17 |
| 2022.08.03. 12:45 | 17 |
| 2022.08.03. 13:00 | 17 |
| 2022.08.03. 13:15 | 17 |
| 2022.08.03. 13:30 | 17 |
| 2022.08.03. 13:45 | 17 |
| 2022.08.03. 14:00 | 17 |
| 2022.08.03. 14:15 | 17 |
| 2022.08.03. 14:30 | 17 |
| 2022.08.03. 14:45 | 17 |
| 2022.08.03. 15:00 | 17 |
| 2022.08.03. 15:15 | 17 |
| 2022.08.03. 15:30 | 17 |
| 2022.08.03. 15:45 | 17 |
| 2022.08.03. 16:00 | 17 |
| 2022.08.03. 16:15 | 17 |
| 2022.08.03. 16:30 | 17 |
| 2022.08.03. 16:45 | 17 |
| 2022.08.03. 17:00 | 17 |
| 2022.08.03. 17:15 | 17 |
| 2022.08.03. 17:30 | 17 |
| 2022.08.03. 17:45 | 17 |
| 2022.08.03. 18:00 | 17 |
| 2022.08.03. 18:15 | 17 |
| 2022.08.03. 18:30 | 17 |
| 2022.08.03. 18:45 | 17 |
| 2022.08.03. 19:00 | 17 |
| 2022.08.03. 19:15 | 17 |
| 2022.08.03. 19:30 | 17 |
| 2022.08.03. 19:45 | 17 |
| 2022.08.03. 20:00 | 17 |
| 2022.08.03. 20:15 | 17 |
| 2022.08.03. 20:30 | 17 |
| 2022.08.03. 20:45 | 17 |
| 2022.08.03. 21:00 | 17 |
| 2022.08.03. 21:15 | 17 |
| 2022.08.03. 21:30 | 17 |
| 2022.08.03. 21:45 | 17 |
| 2022.08.03. 22:00 | 17 |
| 2022.08.03. 22:15 | 17 |
| 2022.08.03. 22:30 | 17 |
| 2022.08.03. 22:45 | 17 |
| 2022.08.03. 23:00 | 17 |
| 2022.08.03. 23:15 | 17 |
| 2022.08.03. 23:30 | 17 |
| 2022.08.03. 23:45 | 17 |
| 2022.08.04. 00:00 | 17 |
| 2022.08.04. 00:15 | 17 |
| 2022.08.04. 00:30 | 17 |
| 2022.08.04. 00:45 | 17 |
| 2022.08.04. 01:00 | 17 |
| 2022.08.04. 01:15 | 17 |
| 2022.08.04. 01:30 | 17 |
| 2022.08.04. 01:45 | 17 |
| 2022.08.04. 02:00 | 17 |
| 2022.08.04. 02:15 | 17 |
| 2022.08.04. 02:30 | 17 |
| 2022.08.04. 02:45 | 17 |
| 2022.08.04. 03:00 | 17 |
| 2022.08.04. 03:15 | 17 |
| 2022.08.04. 03:30 | 17 |
| 2022.08.04. 03:45 | 17 |
| 2022.08.04. 04:00 | 17 |
| 2022.08.04. 04:15 | 17 |
| 2022.08.04. 04:30 | 17 |
| 2022.08.04. 04:45 | 17 |
| 2022.08.04. 05:00 | 17 |
| 2022.08.04. 05:15 | 17 |
| 2022.08.04. 05:30 | 17 |
| 2022.08.04. 05:45 | 17 |
| 2022.08.04. 06:00 | 17 |
| 2022.08.04. 06:15 | 17 |
| 2022.08.04. 06:30 | 17 |
| 2022.08.04. 06:45 | 17 |
| 2022.08.04. 07:00 | 17 |
| 2022.08.04. 07:15 | 17 |
| 2022.08.04. 07:30 | 17 |
| 2022.08.04. 07:45 | 17 |
| 2022.08.04. 08:00 | 17 |
| 2022.08.04. 08:15 | 17 |
| 2022.08.04. 08:30 | 17 |
| 2022.08.04. 08:45 | 17 |
| 2022.08.04. 09:00 | 17 |
| 2022.08.04. 09:15 | 17 |
| 2022.08.04. 09:30 | 17 |
| 2022.08.04. 09:45 | 17 |
| 2022.08.04. 10:00 | 17 |
| 2022.08.04. 10:15 | 17 |
| 2022.08.04. 10:30 | 17 |
| 2022.08.04. 10:45 | 17 |
| 2022.08.04. 11:00 | 17 |
| 2022.08.04. 11:15 | 17 |
| 2022.08.04. 11:30 | 17 |
| 2022.08.04. 11:45 | 17 |
| 2022.08.04. 12:00 | 17 |
| 2022.08.04. 12:15 | 17 |
| 2022.08.04. 12:30 | 17 |
| 2022.08.04. 12:45 | 17 |
| 2022.08.04. 13:00 | 17 |
| 2022.08.04. 13:15 | 17 |
| 2022.08.04. 13:30 | 17 |
| 2022.08.04. 13:45 | 17 |
| 2022.08.04. 14:00 | 17 |
| 2022.08.04. 14:15 | 17 |
| 2022.08.04. 14:30 | 17 |
| 2022.08.04. 14:45 | 17 |
| 2022.08.04. 15:00 | 17 |
| 2022.08.04. 15:15 | 17 |
| 2022.08.04. 15:30 | 17 |
| 2022.08.04. 15:45 | 17 |
| 2022.08.04. 16:00 | 17 |
| 2022.08.04. 16:15 | 17 |
| 2022.08.04. 16:30 | 17 |
| 2022.08.04. 16:45 | 17 |
| 2022.08.04. 17:00 | 17 |
| 2022.08.04. 17:15 | 17 |
| 2022.08.04. 17:30 | 17 |
| 2022.08.04. 17:45 | 17 |
| 2022.08.04. 18:00 | 17 |
| 2022.08.04. 18:15 | 17 |
| 2022.08.04. 18:30 | 17 |
| 2022.08.04. 18:45 | 17 |
| 2022.08.04. 19:00 | 17 |
| 2022.08.04. 19:15 | 17 |
| 2022.08.04. 19:30 | 17 |
| 2022.08.04. 19:45 | 17 |
| 2022.08.04. 20:00 | 17 |
| 2022.08.04. 20:15 | 17 |
| 2022.08.04. 20:30 | 17 |
| 2022.08.04. 20:45 | 17 |
| 2022.08.04. 21:00 | 17 |
| 2022.08.04. 21:15 | 17 |
| 2022.08.04. 21:30 | 17 |
| 2022.08.04. 21:45 | 17 |
| 2022.08.04. 22:00 | 17 |
| 2022.08.04. 22:15 | 17 |
| 2022.08.04. 22:30 | 17 |
| 2022.08.04. 22:45 | 17 |
| 2022.08.04. 23:00 | 17 |
| 2022.08.04. 23:15 | 17 |
| 2022.08.04. 23:30 | 17 |
| 2022.08.04. 23:45 | 17 |
| 2022.08.05. 00:00 | 17 |
| 2022.08.05. 00:15 | 17 |
| 2022.08.05. 00:30 | 17 |
| 2022.08.05. 00:45 | 17 |
| 2022.08.05. 01:00 | 17 |
| 2022.08.05. 01:15 | 17 |
| 2022.08.05. 01:30 | 17 |
| 2022.08.05. 01:45 | 17 |
| 2022.08.05. 02:00 | 17 |
| 2022.08.05. 02:15 | 17 |
| 2022.08.05. 02:30 | 17 |
| 2022.08.05. 02:45 | 17 |
| 2022.08.05. 03:00 | 17 |
| 2022.08.05. 03:15 | 17 |
| 2022.08.05. 03:30 | 17 |
| 2022.08.05. 03:45 | 17 |
| 2022.08.05. 04:00 | 17 |
| 2022.08.05. 04:15 | 17 |
| 2022.08.05. 04:30 | 17 |
| 2022.08.05. 04:45 | 17 |
| 2022.08.05. 05:00 | 17 |
| 2022.08.05. 05:15 | 17 |
| 2022.08.05. 05:30 | 17 |
| 2022.08.05. 05:45 | 17 |
| 2022.08.05. 06:00 | 17 |
| 2022.08.05. 06:15 | 17 |
| 2022.08.05. 06:30 | 17 |
| 2022.08.05. 06:45 | 17 |
| 2022.08.05. 07:00 | 17 |
| 2022.08.05. 07:15 | 17 |
| 2022.08.05. 07:30 | 17 |
| 2022.08.05. 07:45 | 17 |
| 2022.08.05. 08:00 | 17 |
| 2022.08.05. 08:15 | 17 |
| 2022.08.05. 08:30 | 17 |
| 2022.08.05. 08:45 | 17 |
| 2022.08.05. 09:00 | 17 |
| 2022.08.05. 09:15 | 17 |
| 2022.08.05. 09:30 | 17 |
| 2022.08.05. 09:45 | 17 |
| 2022.08.05. 10:00 | 17 |
| 2022.08.05. 10:15 | 17 |
| 2022.08.05. 10:30 | 17 |
| 2022.08.05. 10:45 | 17 |
| 2022.08.05. 11:00 | 17 |
| 2022.08.05. 11:15 | 17 |
| 2022.08.05. 11:30 | 17 |
| 2022.08.05. 11:45 | 17 |
| 2022.08.05. 12:00 | 17 |
| 2022.08.05. 12:15 | 17 |
| 2022.08.05. 12:30 | 17 |
| 2022.08.05. 12:45 | 17 |
| 2022.08.05. 13:00 | 17 |
| 2022.08.05. 13:15 | 17 |
| 2022.08.05. 13:30 | 17 |
| 2022.08.05. 13:45 | 17 |
| 2022.08.05. 14:00 | 17 |
| 2022.08.05. 14:15 | 17 |
| 2022.08.05. 14:30 | 17 |
| 2022.08.05. 14:45 | 17 |
| 2022.08.05. 15:00 | 17 |
| 2022.08.05. 15:15 | 17 |
| 2022.08.05. 15:30 | 17 |
| 2022.08.05. 15:45 | 17 |
| 2022.08.05. 16:00 | 17 |
| 2022.08.05. 16:15 | 17 |
| 2022.08.05. 16:30 | 17 |
| 2022.08.05. 16:45 | 17 |
| 2022.08.05. 17:00 | 17 |
| 2022.08.05. 17:15 | 17 |
| 2022.08.05. 17:30 | 17 |
| 2022.08.05. 17:45 | 17 |
| 2022.08.05. 18:00 | 17 |
| 2022.08.05. 18:15 | 17 |
| 2022.08.05. 18:30 | 17 |
| 2022.08.05. 18:45 | 17 |
| 2022.08.05. 19:00 | 17 |
| 2022.08.05. 19:15 | 17 |
| 2022.08.05. 19:30 | 17 |
| 2022.08.05. 19:45 | 17 |
| 2022.08.05. 20:00 | 17 |
| 2022.08.05. 20:15 | 17 |
| 2022.08.05. 20:30 | 17 |
| 2022.08.05. 20:45 | 17 |
| 2022.08.05. 21:00 | 17 |
| 2022.08.05. 21:15 | 17 |
| 2022.08.05. 21:30 | 17 |
| 2022.08.05. 21:45 | 17 |
| 2022.08.05. 22:00 | 17 |
| 2022.08.05. 22:15 | 17 |
| 2022.08.05. 22:30 | 17 |
| 2022.08.05. 22:45 | 17 |
| 2022.08.05. 23:00 | 17 |
| 2022.08.05. 23:15 | 17 |
| 2022.08.05. 23:30 | 17 |
| 2022.08.05. 23:45 | 17 |
| 2022.08.06. 00:00 | 17 |
| 2022.08.06. 00:15 | 17 |
| 2022.08.06. 00:30 | 17 |
| 2022.08.06. 00:45 | 17 |
| 2022.08.06. 01:00 | 17 |
| 2022.08.06. 01:15 | 17 |
| 2022.08.06. 01:30 | 17 |
| 2022.08.06. 01:45 | 17 |
| 2022.08.06. 02:00 | 17 |
| 2022.08.06. 02:15 | 17 |
| 2022.08.06. 02:30 | 17 |
| 2022.08.06. 02:45 | 17 |
| 2022.08.06. 03:00 | 17 |
| 2022.08.06. 03:15 | 17 |
| 2022.08.06. 03:30 | 17 |
| 2022.08.06. 03:45 | 17 |
| 2022.08.06. 04:00 | 17 |
| 2022.08.06. 04:15 | 17 |
| 2022.08.06. 04:30 | 17 |
| 2022.08.06. 04:45 | 17 |
| 2022.08.06. 05:00 | 17 |
| 2022.08.06. 05:15 | 17 |
| 2022.08.06. 05:30 | 17 |
| 2022.08.06. 05:45 | 17 |
| 2022.08.06. 06:00 | 17 |
| 2022.08.06. 06:15 | 17 |
| 2022.08.06. 06:30 | 17 |
| 2022.08.06. 06:45 | 17 |
| 2022.08.06. 07:00 | 17 |
| 2022.08.06. 07:15 | 17 |
| 2022.08.06. 07:30 | 17 |
| 2022.08.06. 07:45 | 17 |
| 2022.08.06. 08:00 | 17 |
| 2022.08.06. 08:15 | 17 |
| 2022.08.06. 08:30 | 17 |
| 2022.08.06. 08:45 | 17 |
| 2022.08.06. 09:00 | 17 |
| 2022.08.06. 09:15 | 17 |
| 2022.08.06. 09:30 | 17 |
| 2022.08.06. 09:45 | 17 |
| 2022.08.06. 10:00 | 17 |
| 2022.08.06. 10:15 | 17 |
| 2022.08.06. 10:30 | 17 |
| 2022.08.06. 10:45 | 17 |
| 2022.08.06. 11:00 | 17 |
| 2022.08.06. 11:15 | 17 |
| 2022.08.06. 11:30 | 17 |
| 2022.08.06. 11:45 | 17 |
| 2022.08.06. 12:00 | 17 |
| 2022.08.06. 12:15 | 17 |
| 2022.08.06. 12:30 | 17 |
| 2022.08.06. 12:45 | 17 |
| 2022.08.06. 13:00 | 17 |
| 2022.08.06. 13:15 | 17 |
| 2022.08.06. 13:30 | 17 |
| 2022.08.06. 13:45 | 17 |
| 2022.08.06. 14:00 | 17 |
| 2022.08.06. 14:15 | 17 |
| 2022.08.06. 14:30 | 17 |
| 2022.08.06. 14:45 | 17 |
| 2022.08.06. 15:00 | 17 |
| 2022.08.06. 15:15 | 17 |
| 2022.08.06. 15:30 | 17 |
| 2022.08.06. 15:45 | 17 |
| 2022.08.06. 16:00 | 17 |
| 2022.08.06. 16:15 | 17 |
| 2022.08.06. 16:30 | 17 |
| 2022.08.06. 16:45 | 17 |
| 2022.08.06. 17:00 | 17 |
| 2022.08.06. 17:15 | 17 |
| 2022.08.06. 17:30 | 17 |
| 2022.08.06. 17:45 | 17 |
| 2022.08.06. 18:00 | 17 |
| 2022.08.06. 18:15 | 17 |
| 2022.08.06. 18:30 | 17 |
| 2022.08.06. 18:45 | 17 |
| 2022.08.06. 19:00 | 17 |
| 2022.08.06. 19:15 | 17 |
| 2022.08.06. 19:30 | 17 |
| 2022.08.06. 19:45 | 17 |
| 2022.08.06. 20:00 | 17 |
| 2022.08.06. 20:15 | 17 |
| 2022.08.06. 20:30 | 17 |
| 2022.08.06. 20:45 | 17 |
| 2022.08.06. 21:00 | 17 |
| 2022.08.06. 21:15 | 17 |
| 2022.08.06. 21:30 | 17 |
| 2022.08.06. 21:45 | 17 |
| 2022.08.06. 22:00 | 17 |
| 2022.08.06. 22:15 | 17 |
| 2022.08.06. 22:30 | 17 |
| 2022.08.06. 22:45 | 17 |
| 2022.08.06. 23:00 | 17 |
| 2022.08.06. 23:15 | 17 |
| 2022.08.06. 23:30 | 17 |
| 2022.08.06. 23:45 | 17 |
| 2022.08.07. 00:00 | 17 |
| 2022.08.07. 00:15 | 17 |
| 2022.08.07. 00:30 | 17 |
| 2022.08.07. 00:45 | 17 |
| 2022.08.07. 01:00 | 17 |
| 2022.08.07. 01:15 | 17 |
| 2022.08.07. 01:30 | 17 |
| 2022.08.07. 01:45 | 17 |
| 2022.08.07. 02:00 | 17 |
| 2022.08.07. 02:15 | 17 |
| 2022.08.07. 02:30 | 17 |
| 2022.08.07. 02:45 | 17 |
| 2022.08.07. 03:00 | 17 |
| 2022.08.07. 03:15 | 17 |
| 2022.08.07. 03:30 | 17 |
| 2022.08.07. 03:45 | 17 |
| 2022.08.07. 04:00 | 17 |
| 2022.08.07. 04:15 | 17 |
| 2022.08.07. 04:30 | 17 |
| 2022.08.07. 04:45 | 17 |
| 2022.08.07. 05:00 | 17 |
| 2022.08.07. 05:15 | 17 |
| 2022.08.07. 05:30 | 17 |
| 2022.08.07. 05:45 | 17 |
| 2022.08.07. 06:00 | 17 |
| 2022.08.07. 06:15 | 17 |
| 2022.08.07. 06:30 | 17 |
| 2022.08.07. 06:45 | 17 |
| 2022.08.07. 07:00 | 17 |
| 2022.08.07. 07:15 | 17 |
| 2022.08.07. 07:30 | 17 |
| 2022.08.07. 07:45 | 17 |
| 2022.08.07. 08:00 | 17 |
| 2022.08.07. 08:15 | 17 |
| 2022.08.07. 08:30 | 17 |
| 2022.08.07. 08:45 | 17 |
| 2022.08.07. 09:00 | 17 |
| 2022.08.07. 09:15 | 17 |
| 2022.08.07. 09:30 | 17 |
| 2022.08.07. 09:45 | 17 |
| 2022.08.07. 10:00 | 17 |
| 2022.08.07. 10:15 | 17 |
| 2022.08.07. 10:30 | 17 |
| 2022.08.07. 10:45 | 17 |
| 2022.08.07. 11:00 | 17 |
| 2022.08.07. 11:15 | 17 |
| 2022.08.07. 11:30 | 17 |
| 2022.08.07. 11:45 | 17 |
| 2022.08.07. 12:00 | 17 |
| 2022.08.07. 12:15 | 17 |
| 2022.08.07. 12:30 | 17 |
| 2022.08.07. 12:45 | 17 |
| 2022.08.07. 13:00 | 17 |
| 2022.08.07. 13:15 | 17 |
| 2022.08.07. 13:30 | 17 |
| 2022.08.07. 13:45 | 17 |
| 2022.08.07. 14:00 | 17 |
| 2022.08.07. 14:15 | 17 |
| 2022.08.07. 14:30 | 17 |
| 2022.08.07. 14:45 | 17 |
| 2022.08.07. 15:00 | 17 |
| 2022.08.07. 15:15 | 17 |
| 2022.08.07. 15:30 | 17 |
| 2022.08.07. 15:45 | 17 |
| 2022.08.07. 16:00 | 17 |
| 2022.08.07. 16:15 | 17 |
| 2022.08.07. 16:30 | 17 |
| 2022.08.07. 16:45 | 17 |
| 2022.08.07. 17:00 | 17 |
| 2022.08.07. 17:15 | 17 |
| 2022.08.07. 17:30 | 17 |
| 2022.08.07. 17:45 | 17 |
| 2022.08.07. 18:00 | 17 |
| 2022.08.07. 18:15 | 17 |
| 2022.08.07. 18:30 | 17 |
| 2022.08.07. 18:45 | 17 |
| 2022.08.07. 19:00 | 17 |
| 2022.08.07. 19:15 | 17 |
| 2022.08.07. 19:30 | 17 |
| 2022.08.07. 19:45 | 17 |
| 2022.08.07. 20:00 | 17 |
| 2022.08.07. 20:15 | 17 |
| 2022.08.07. 20:30 | 17 |
| 2022.08.07. 20:45 | 17 |
| 2022.08.07. 21:00 | 17 |
| 2022.08.07. 21:15 | 17 |
| 2022.08.07. 21:30 | 17 |
| 2022.08.07. 21:45 | 17 |
| 2022.08.07. 22:00 | 17 |
| 2022.08.07. 22:15 | 17 |
| 2022.08.07. 22:30 | 17 |
| 2022.08.07. 22:45 | 17 |
| 2022.08.07. 23:00 | 17 |
| 2022.08.07. 23:15 | 17 |
| 2022.08.07. 23:30 | 17 |
| 2022.08.07. 23:45 | 17 |
| 2022.08.08. 00:00 | 17 |
| 2022.08.08. 00:15 | 17 |
| 2022.08.08. 00:30 | 17 |
| 2022.08.08. 00:45 | 17 |
| 2022.08.08. 01:00 | 17 |
| 2022.08.08. 01:15 | 17 |
| 2022.08.08. 01:30 | 17 |
| 2022.08.08. 01:45 | 17 |
| 2022.08.08. 02:00 | 17 |
| 2022.08.08. 02:15 | 17 |
| 2022.08.08. 02:30 | 17 |
| 2022.08.08. 02:45 | 17 |
| 2022.08.08. 03:00 | 17 |
| 2022.08.08. 03:15 | 17 |
| 2022.08.08. 03:30 | 17 |
| 2022.08.08. 03:45 | 17 |
| 2022.08.08. 04:00 | 17 |
| 2022.08.08. 04:15 | 17 |
| 2022.08.08. 04:30 | 17 |
| 2022.08.08. 04:45 | 17 |
| 2022.08.08. 05:00 | 17 |
| 2022.08.08. 05:15 | 17 |
| 2022.08.08. 05:30 | 17 |
| 2022.08.08. 05:45 | 17 |
| 2022.08.08. 06:00 | 17 |
| 2022.08.08. 06:15 | 17 |
| 2022.08.08. 06:30 | 17 |
| 2022.08.08. 06:45 | 17 |
| 2022.08.08. 07:00 | 17 |
| 2022.08.08. 07:15 | 17 |
| 2022.08.08. 07:30 | 17 |
| 2022.08.08. 07:45 | 17 |
| 2022.08.08. 08:00 | 17 |
| 2022.08.08. 08:15 | 17 |
| 2022.08.08. 08:30 | 17 |
| 2022.08.08. 08:45 | 17 |
| 2022.08.08. 09:00 | 17 |
| 2022.08.08. 09:15 | 17 |
| 2022.08.08. 09:30 | 17 |
| 2022.08.08. 09:45 | 17 |
| 2022.08.08. 10:00 | 17 |
| 2022.08.08. 10:15 | 17 |
| 2022.08.08. 10:30 | 17 |
| 2022.08.08. 10:45 | 17 |
| 2022.08.08. 11:00 | 17 |
| 2022.08.08. 11:15 | 17 |
| 2022.08.08. 11:30 | 17 |
| 2022.08.08. 11:45 | 17 |
| 2022.08.08. 12:00 | 17 |
| 2022.08.08. 12:15 | 17 |
| 2022.08.08. 12:30 | 17 |
| 2022.08.08. 12:45 | 17 |
| 2022.08.08. 13:00 | 17 |
| 2022.08.08. 13:15 | 17 |
| 2022.08.08. 13:30 | 17 |
| 2022.08.08. 13:45 | 17 |
| 2022.08.08. 14:00 | 17 |
| 2022.08.08. 14:15 | 17 |
| 2022.08.08. 14:30 | 17 |
| 2022.08.08. 14:45 | 17 |
| 2022.08.08. 15:00 | 17 |
| 2022.08.08. 15:15 | 17 |
| 2022.08.08. 15:30 | 17 |
| 2022.08.08. 15:45 | 17 |
| 2022.08.08. 16:00 | 17 |
| 2022.08.08. 16:15 | 17 |
| 2022.08.08. 16:30 | 17 |
| 2022.08.08. 16:45 | 17 |
| 2022.08.08. 17:00 | 17 |
| 2022.08.08. 17:15 | 17 |
| 2022.08.08. 17:30 | 17 |
| 2022.08.08. 17:45 | 17 |
| 2022.08.08. 18:00 | 17 |
| 2022.08.08. 18:15 | 17 |
| 2022.08.08. 18:30 | 17 |
| 2022.08.08. 18:45 | 17 |
| 2022.08.08. 19:00 | 17 |
| 2022.08.08. 19:15 | 17 |
| 2022.08.08. 19:30 | 17 |
| 2022.08.08. 19:45 | 17 |
| 2022.08.08. 20:00 | 17 |
| 2022.08.08. 20:15 | 17 |
| 2022.08.08. 20:30 | 17 |
| 2022.08.08. 20:45 | 17 |
| 2022.08.08. 21:00 | 17 |
| 2022.08.08. 21:15 | 17 |
| 2022.08.08. 21:30 | 17 |
| 2022.08.08. 21:45 | 17 |
| 2022.08.08. 22:00 | 17 |
| 2022.08.08. 22:15 | 17 |
| 2022.08.08. 22:30 | 17 |
| 2022.08.08. 22:45 | 17 |
| 2022.08.08. 23:00 | 17 |
| 2022.08.08. 23:15 | 17 |
| 2022.08.08. 23:30 | 17 |
| 2022.08.08. 23:45 | 17 |
| 2022.08.09. 00:00 | 17 |
| 2022.08.09. 00:15 | 17 |
| 2022.08.09. 00:30 | 17 |
| 2022.08.09. 00:45 | 17 |
| 2022.08.09. 01:00 | 17 |
| 2022.08.09. 01:15 | 17 |
| 2022.08.09. 01:30 | 17 |
| 2022.08.09. 01:45 | 17 |
| 2022.08.09. 02:00 | 17 |
| 2022.08.09. 02:15 | 17 |
| 2022.08.09. 02:30 | 17 |
| 2022.08.09. 02:45 | 17 |
| 2022.08.09. 03:00 | 17 |
| 2022.08.09. 03:15 | 17 |
| 2022.08.09. 03:30 | 17 |
| 2022.08.09. 03:45 | 17 |
| 2022.08.09. 04:00 | 17 |
| 2022.08.09. 04:15 | 17 |
| 2022.08.09. 04:30 | 17 |
| 2022.08.09. 04:45 | 17 |
| 2022.08.09. 05:00 | 17 |
| 2022.08.09. 05:15 | 17 |
| 2022.08.09. 05:30 | 17 |
| 2022.08.09. 05:45 | 17 |
| 2022.08.09. 06:00 | 17 |
| 2022.08.09. 06:15 | 17 |
| 2022.08.09. 06:30 | 17 |
| 2022.08.09. 06:45 | 17 |
| 2022.08.09. 07:00 | 17 |
| 2022.08.09. 07:15 | 17 |
| 2022.08.09. 07:30 | 17 |
| 2022.08.09. 07:45 | 17 |
| 2022.08.09. 08:00 | 17 |
| 2022.08.09. 08:15 | 17 |
| 2022.08.09. 08:30 | 17 |
| 2022.08.09. 08:45 | 17 |
| 2022.08.09. 09:00 | 17 |
| 2022.08.09. 09:15 | 17 |
| 2022.08.09. 09:30 | 17 |
| 2022.08.09. 09:45 | 17 |
| 2022.08.09. 10:00 | 17 |
| 2022.08.09. 10:15 | 17 |
| 2022.08.09. 10:30 | 17 |
| 2022.08.09. 10:45 | 17 |
| 2022.08.09. 11:00 | 17 |
| 2022.08.09. 11:15 | 17 |
| 2022.08.09. 11:30 | 17 |
| 2022.08.09. 11:45 | 17 |
| 2022.08.09. 12:00 | 17 |
| 2022.08.09. 12:15 | 17 |
| 2022.08.09. 12:30 | 17 |
| 2022.08.09. 12:45 | 17 |
| 2022.08.09. 13:00 | 17 |
| 2022.08.09. 13:15 | 17 |
| 2022.08.09. 13:30 | 17 |
| 2022.08.09. 13:45 | 17 |
| 2022.08.09. 14:00 | 17 |
| 2022.08.09. 14:15 | 17 |
| 2022.08.09. 14:30 | 17 |
| 2022.08.09. 14:45 | 17 |
| 2022.08.09. 15:00 | 17 |
| 2022.08.09. 15:15 | 17 |
| 2022.08.09. 15:30 | 17 |
| 2022.08.09. 15:45 | 17 |
| 2022.08.09. 16:00 | 17 |
| 2022.08.09. 16:15 | 17 |
| 2022.08.09. 16:30 | 17 |
| 2022.08.09. 16:45 | 17 |
| 2022.08.09. 17:00 | 17 |
| 2022.08.09. 17:15 | 17 |
| 2022.08.09. 17:30 | 17 |
| 2022.08.09. 17:45 | 17 |
| 2022.08.09. 18:00 | 17 |
| 2022.08.09. 18:15 | 17 |
| 2022.08.09. 18:30 | 17 |
| 2022.08.09. 18:45 | 17 |
| 2022.08.09. 19:00 | 17 |
| 2022.08.09. 19:15 | 17 |
| 2022.08.09. 19:30 | 17 |
| 2022.08.09. 19:45 | 17 |
| 2022.08.09. 20:00 | 17 |
| 2022.08.09. 20:15 | 17 |
| 2022.08.09. 20:30 | 17 |
| 2022.08.09. 20:45 | 17 |
| 2022.08.09. 21:00 | 17 |
| 2022.08.09. 21:15 | 17 |
| 2022.08.09. 21:30 | 17 |
| 2022.08.09. 21:45 | 17 |
| 2022.08.09. 22:00 | 17 |
| 2022.08.09. 22:15 | 17 |
| 2022.08.09. 22:30 | 17 |
| 2022.08.09. 22:45 | 17 |
| 2022.08.09. 23:00 | 17 |
| 2022.08.09. 23:15 | 17 |
| 2022.08.09. 23:30 | 17 |
| 2022.08.09. 23:45 | 17 |
| 2022.08.10. 00:00 | 17 |
| 2022.08.10. 00:15 | 17 |
| 2022.08.10. 00:30 | 17 |
| 2022.08.10. 00:45 | 17 |
| 2022.08.10. 01:00 | 17 |
| 2022.08.10. 01:15 | 17 |
| 2022.08.10. 01:30 | 17 |
| 2022.08.10. 01:45 | 17 |
| 2022.08.10. 02:00 | 17 |
| 2022.08.10. 02:15 | 17 |
| 2022.08.10. 02:30 | 17 |
| 2022.08.10. 02:45 | 17 |
| 2022.08.10. 03:00 | 17 |
| 2022.08.10. 03:15 | 17 |
| 2022.08.10. 03:30 | 17 |
| 2022.08.10. 03:45 | 17 |
| 2022.08.10. 04:00 | 17 |
| 2022.08.10. 04:15 | 17 |
| 2022.08.10. 04:30 | 17 |
| 2022.08.10. 04:45 | 17 |
| 2022.08.10. 05:00 | 17 |
| 2022.08.10. 05:15 | 17 |
| 2022.08.10. 05:30 | 17 |
| 2022.08.10. 05:45 | 17 |
| 2022.08.10. 06:00 | 17 |
| 2022.08.10. 06:15 | 17 |
| 2022.08.10. 06:30 | 17 |
| 2022.08.10. 06:45 | 17 |
| 2022.08.10. 07:00 | 17 |
| 2022.08.10. 07:15 | 17 |
| 2022.08.10. 07:30 | 17 |
| 2022.08.10. 07:45 | 17 |
| 2022.08.10. 08:00 | 17 |
| 2022.08.10. 08:15 | 17 |
| 2022.08.10. 08:30 | 17 |
| 2022.08.10. 08:45 | 17 |
| 2022.08.10. 09:00 | 17 |
| 2022.08.10. 09:15 | 17 |
| 2022.08.10. 09:30 | 17 |
| 2022.08.10. 09:45 | 17 |
| 2022.08.10. 10:00 | 17 |
| 2022.08.10. 10:15 | 17 |
| 2022.08.10. 10:30 | 17 |
| 2022.08.10. 10:45 | 17 |
| 2022.08.10. 11:00 | 17 |
| 2022.08.10. 11:15 | 17 |
| 2022.08.10. 11:30 | 17 |
| 2022.08.10. 11:45 | 17 |
| 2022.08.10. 12:00 | 17 |
| 2022.08.10. 12:15 | 17 |
| 2022.08.10. 12:30 | 17 |
| 2022.08.10. 12:45 | 17 |
| 2022.08.10. 13:00 | 17 |
| 2022.08.10. 13:15 | 17 |
| 2022.08.10. 13:30 | 17 |
| 2022.08.10. 13:45 | 17 |
| 2022.08.10. 14:00 | 17 |
| 2022.08.10. 14:15 | 17 |
| 2022.08.10. 14:30 | 17 |
| 2022.08.10. 14:45 | 17 |
| 2022.08.10. 15:00 | 17 |
| 2022.08.10. 15:15 | 17 |
| 2022.08.10. 15:30 | 17 |
| 2022.08.10. 15:45 | 17 |
| 2022.08.10. 16:00 | 17 |
| 2022.08.10. 16:15 | 17 |
| 2022.08.10. 16:30 | 17 |
| 2022.08.10. 16:45 | 17 |
| 2022.08.10. 17:00 | 17 |
| 2022.08.10. 17:15 | 17 |
| 2022.08.10. 17:30 | 17 |
| 2022.08.10. 17:45 | 17 |
| 2022.08.10. 18:00 | 17 |
| 2022.08.10. 18:15 | 17 |
| 2022.08.10. 18:30 | 17 |
| 2022.08.10. 18:45 | 17 |
| 2022.08.10. 19:00 | 17 |
| 2022.08.10. 19:15 | 17 |
| 2022.08.10. 19:30 | 17 |
| 2022.08.10. 19:45 | 17 |
| 2022.08.10. 20:00 | 17 |
| 2022.08.10. 20:15 | 17 |
| 2022.08.10. 20:30 | 17 |
| 2022.08.10. 20:45 | 17 |
| 2022.08.10. 21:00 | 17 |
| 2022.08.10. 21:15 | 17 |
| 2022.08.10. 21:30 | 17 |
| 2022.08.10. 21:45 | 17 |
| 2022.08.10. 22:00 | 17 |
| 2022.08.10. 22:15 | 17 |
| 2022.08.10. 22:30 | 17 |
| 2022.08.10. 22:45 | 17 |
| 2022.08.10. 23:00 | 17 |
| 2022.08.10. 23:15 | 17 |
| 2022.08.10. 23:30 | 17 |
| 2022.08.10. 23:45 | 17 |
| 2022.08.11. 00:00 | 17 |
| 2022.08.11. 00:15 | 17 |
| 2022.08.11. 00:30 | 17 |
| 2022.08.11. 00:45 | 17 |
| 2022.08.11. 01:00 | 17 |
| 2022.08.11. 01:15 | 17 |
| 2022.08.11. 01:30 | 17 |
| 2022.08.11. 01:45 | 17 |
| 2022.08.11. 02:00 | 17 |
| 2022.08.11. 02:15 | 17 |
| 2022.08.11. 02:30 | 17 |
| 2022.08.11. 02:45 | 17 |
| 2022.08.11. 03:00 | 17 |
| 2022.08.11. 03:15 | 17 |
| 2022.08.11. 03:30 | 17 |
| 2022.08.11. 03:45 | 17 |
| 2022.08.11. 04:00 | 17 |
| 2022.08.11. 04:15 | 17 |
| 2022.08.11. 04:30 | 17 |
| 2022.08.11. 04:45 | 17 |
| 2022.08.11. 05:00 | 17 |
| 2022.08.11. 05:15 | 17 |
| 2022.08.11. 05:30 | 17 |
| 2022.08.11. 05:45 | 17 |
| 2022.08.11. 06:00 | 17 |
| 2022.08.11. 06:15 | 17 |
| 2022.08.11. 06:30 | 17 |
| 2022.08.11. 06:45 | 17 |
| 2022.08.11. 07:00 | 17 |
| 2022.08.11. 07:15 | 17 |
| 2022.08.11. 07:30 | 17 |
| 2022.08.11. 07:45 | 17 |
| 2022.08.11. 08:00 | 17 |
| 2022.08.11. 08:15 | 17 |
| 2022.08.11. 08:30 | 17 |
| 2022.08.11. 08:45 | 17 |
| 2022.08.11. 09:00 | 17 |
| 2022.08.11. 09:15 | 17 |
| 2022.08.11. 09:30 | 17 |
| 2022.08.11. 09:45 | 17 |
| 2022.08.11. 10:00 | 17 |
| 2022.08.11. 10:15 | 17 |
| 2022.08.11. 10:30 | 17 |
| 2022.08.11. 10:45 | 17 |
| 2022.08.11. 11:00 | 17 |
| 2022.08.11. 11:15 | 17 |
| 2022.08.11. 11:30 | 17 |
| 2022.08.11. 11:45 | 17 |
| 2022.08.11. 12:00 | 17 |
| 2022.08.11. 12:15 | 17 |
| 2022.08.11. 12:30 | 17 |
| 2022.08.11. 12:45 | 17 |
| 2022.08.11. 13:00 | 17 |
| 2022.08.11. 13:15 | 17 |
| 2022.08.11. 13:30 | 17 |
| 2022.08.11. 13:45 | 17 |
| 2022.08.11. 14:00 | 17 |
| 2022.08.11. 14:15 | 17 |
| 2022.08.11. 14:30 | 17 |
| 2022.08.11. 14:45 | 17 |
| 2022.08.11. 15:00 | 17 |
| 2022.08.11. 15:15 | 17 |
| 2022.08.11. 15:30 | 17 |
| 2022.08.11. 15:45 | 17 |
| 2022.08.11. 16:00 | 17 |
| 2022.08.11. 16:15 | 17 |
| 2022.08.11. 16:30 | 17 |
| 2022.08.11. 16:45 | 17 |
| 2022.08.11. 17:00 | 17 |
| 2022.08.11. 17:15 | 17 |
| 2022.08.11. 17:30 | 17 |
| 2022.08.11. 17:45 | 17 |
| 2022.08.11. 18:00 | 17 |
| 2022.08.11. 18:15 | 17 |
| 2022.08.11. 18:30 | 17 |
| 2022.08.11. 18:45 | 17 |
| 2022.08.11. 19:00 | 17 |
| 2022.08.11. 19:15 | 17 |
| 2022.08.11. 19:30 | 17 |
| 2022.08.11. 19:45 | 17 |
| 2022.08.11. 20:00 | 17 |
| 2022.08.11. 20:15 | 17 |
| 2022.08.11. 20:30 | 17 |
| 2022.08.11. 20:45 | 17 |
| 2022.08.11. 21:00 | 17 |
| 2022.08.11. 21:15 | 17 |
| 2022.08.11. 21:30 | 17 |
| 2022.08.11. 21:45 | 17 |
| 2022.08.11. 22:00 | 17 |
| 2022.08.11. 22:15 | 17 |
| 2022.08.11. 22:30 | 17 |
| 2022.08.11. 22:45 | 17 |
| 2022.08.11. 23:00 | 17 |
| 2022.08.11. 23:15 | 17 |
| 2022.08.11. 23:30 | 17 |
| 2022.08.11. 23:45 | 17 |
| 2022.08.12. 00:00 | 17 |
| 2022.08.12. 00:15 | 17 |
| 2022.08.12. 00:30 | 17 |
| 2022.08.12. 00:45 | 17 |
| 2022.08.12. 01:00 | 17 |
| 2022.08.12. 01:15 | 17 |
| 2022.08.12. 01:30 | 17 |
| 2022.08.12. 01:45 | 17 |
| 2022.08.12. 02:00 | 17 |
| 2022.08.12. 02:15 | 17 |
| 2022.08.12. 02:30 | 17 |
| 2022.08.12. 02:45 | 17 |
| 2022.08.12. 03:00 | 17 |
| 2022.08.12. 03:15 | 17 |
| 2022.08.12. 03:30 | 17 |
| 2022.08.12. 03:45 | 17 |
| 2022.08.12. 04:00 | 17 |
| 2022.08.12. 04:15 | 17 |
| 2022.08.12. 04:30 | 17 |
| 2022.08.12. 04:45 | 17 |
| 2022.08.12. 05:00 | 17 |
| 2022.08.12. 05:15 | 17 |
| 2022.08.12. 05:30 | 17 |
| 2022.08.12. 05:45 | 17 |
| 2022.08.12. 06:00 | 17 |
| 2022.08.12. 06:15 | 17 |
| 2022.08.12. 06:30 | 17 |
| 2022.08.12. 06:45 | 17 |
| 2022.08.12. 07:00 | 17 |
| 2022.08.12. 07:15 | 17 |
| 2022.08.12. 07:30 | 17 |
| 2022.08.12. 07:45 | 17 |
| 2022.08.12. 08:00 | 17 |
| 2022.08.12. 08:15 | 17 |
| 2022.08.12. 08:30 | 17 |
| 2022.08.12. 08:45 | 17 |
| 2022.08.12. 09:00 | 17 |
| 2022.08.12. 09:15 | 17 |
| 2022.08.12. 09:30 | 17 |
| 2022.08.12. 09:45 | 17 |
| 2022.08.12. 10:00 | 17 |
| 2022.08.12. 10:15 | 17 |
| 2022.08.12. 10:30 | 17 |
| 2022.08.12. 10:45 | 17 |
| 2022.08.12. 11:00 | 17 |
| 2022.08.12. 11:15 | 17 |
| 2022.08.12. 11:30 | 17 |
| 2022.08.12. 11:45 | 17 |
| 2022.08.12. 12:00 | 17 |
| 2022.08.12. 12:15 | 17 |
| 2022.08.12. 12:30 | 17 |
| 2022.08.12. 12:45 | 17 |
| 2022.08.12. 13:00 | 17 |
| 2022.08.12. 13:15 | 17 |
| 2022.08.12. 13:30 | 17 |
| 2022.08.12. 13:45 | 17 |
| 2022.08.12. 14:00 | 17 |
| 2022.08.12. 14:15 | 17 |
| 2022.08.12. 14:30 | 17 |
| 2022.08.12. 14:45 | 17 |
| 2022.08.12. 15:00 | 17 |
| 2022.08.12. 15:15 | 17 |
| 2022.08.12. 15:30 | 17 |
| 2022.08.12. 15:45 | 17 |
| 2022.08.12. 16:00 | 17 |
| 2022.08.12. 16:15 | 17 |
| 2022.08.12. 16:30 | 17 |
| 2022.08.12. 16:45 | 17 |
| 2022.08.12. 17:00 | 17 |
| 2022.08.12. 17:15 | 17 |
| 2022.08.12. 17:30 | 17 |
| 2022.08.12. 17:45 | 17 |
| 2022.08.12. 18:00 | 17 |
| 2022.08.12. 18:15 | 17 |
| 2022.08.12. 18:30 | 17 |
| 2022.08.12. 18:45 | 17 |
| 2022.08.12. 19:00 | 17 |
| 2022.08.12. 19:15 | 17 |
| 2022.08.12. 19:30 | 17 |
| 2022.08.12. 19:45 | 17 |
| 2022.08.12. 20:00 | 17 |
| 2022.08.12. 20:15 | 17 |
| 2022.08.12. 20:30 | 17 |
| 2022.08.12. 20:45 | 17 |
| 2022.08.12. 21:00 | 17 |
| 2022.08.12. 21:15 | 17 |
| 2022.08.12. 21:30 | 17 |
| 2022.08.12. 21:45 | 17 |
| 2022.08.12. 22:00 | 17 |
| 2022.08.12. 22:15 | 17 |
| 2022.08.12. 22:30 | 17 |
| 2022.08.12. 22:45 | 17 |
| 2022.08.12. 23:00 | 17 |
| 2022.08.12. 23:15 | 17 |
| 2022.08.12. 23:30 | 17 |
| 2022.08.12. 23:45 | 17 |
| 2022.08.13. 00:00 | 17 |
| 2022.08.13. 00:15 | 17 |
| 2022.08.13. 00:30 | 17 |
| 2022.08.13. 00:45 | 17 |
| 2022.08.13. 01:00 | 17 |
| 2022.08.13. 01:15 | 17 |
| 2022.08.13. 01:30 | 17 |
| 2022.08.13. 01:45 | 17 |
| 2022.08.13. 02:00 | 17 |
| 2022.08.13. 02:15 | 17 |
| 2022.08.13. 02:30 | 17 |
| 2022.08.13. 02:45 | 17 |
| 2022.08.13. 03:00 | 17 |
| 2022.08.13. 03:15 | 17 |
| 2022.08.13. 03:30 | 17 |
| 2022.08.13. 03:45 | 17 |
| 2022.08.13. 04:00 | 17 |
| 2022.08.13. 04:15 | 17 |
| 2022.08.13. 04:30 | 17 |
| 2022.08.13. 04:45 | 17 |
| 2022.08.13. 05:00 | 17 |
| 2022.08.13. 05:15 | 17 |
| 2022.08.13. 05:30 | 17 |
| 2022.08.13. 05:45 | 17 |
| 2022.08.13. 06:00 | 17 |
| 2022.08.13. 06:15 | 17 |
| 2022.08.13. 06:30 | 17 |
| 2022.08.13. 06:45 | 17 |
| 2022.08.13. 07:00 | 17 |
| 2022.08.13. 07:15 | 17 |
| 2022.08.13. 07:30 | 17 |
| 2022.08.13. 07:45 | 17 |
| 2022.08.13. 08:00 | 17 |
| 2022.08.13. 08:15 | 17 |
| 2022.08.13. 08:30 | 17 |
| 2022.08.13. 08:45 | 17 |
| 2022.08.13. 09:00 | 17 |
| 2022.08.13. 09:15 | 17 |
| 2022.08.13. 09:30 | 17 |
| 2022.08.13. 09:45 | 17 |
| 2022.08.13. 10:00 | 17 |
| 2022.08.13. 10:15 | 17 |
| 2022.08.13. 10:30 | 17 |
| 2022.08.13. 10:45 | 17 |
| 2022.08.13. 11:00 | 17 |
| 2022.08.13. 11:15 | 17 |
| 2022.08.13. 11:30 | 17 |
| 2022.08.13. 11:45 | 17 |
| 2022.08.13. 12:00 | 17 |
| 2022.08.13. 12:15 | 17 |
| 2022.08.13. 12:30 | 17 |
| 2022.08.13. 12:45 | 17 |
| 2022.08.13. 13:00 | 17 |
| 2022.08.13. 13:15 | 17 |
| 2022.08.13. 13:30 | 17 |
| 2022.08.13. 13:45 | 17 |
| 2022.08.13. 14:00 | 17 |
| 2022.08.13. 14:15 | 17 |
| 2022.08.13. 14:30 | 17 |
| 2022.08.13. 14:45 | 17 |
| 2022.08.13. 15:00 | 17 |
| 2022.08.13. 15:15 | 17 |
| 2022.08.13. 15:30 | 17 |
| 2022.08.13. 15:45 | 17 |
| 2022.08.13. 16:00 | 17 |
| 2022.08.13. 16:15 | 17 |
| 2022.08.13. 16:30 | 17 |
| 2022.08.13. 16:45 | 17 |
| 2022.08.13. 17:00 | 17 |
| 2022.08.13. 17:15 | 17 |
| 2022.08.13. 17:30 | 17 |
| 2022.08.13. 17:45 | 17 |
| 2022.08.13. 18:00 | 17 |
| 2022.08.13. 18:15 | 17 |
| 2022.08.13. 18:30 | 17 |
| 2022.08.13. 18:45 | 17 |
| 2022.08.13. 19:00 | 17 |
| 2022.08.13. 19:15 | 17 |
| 2022.08.13. 19:30 | 17 |
| 2022.08.13. 19:45 | 17 |
| 2022.08.13. 20:00 | 17 |
| 2022.08.13. 20:15 | 17 |
| 2022.08.13. 20:30 | 17 |
| 2022.08.13. 20:45 | 17 |
| 2022.08.13. 21:00 | 17 |
| 2022.08.13. 21:15 | 17 |
| 2022.08.13. 21:30 | 17 |
| 2022.08.13. 21:45 | 17 |
| 2022.08.13. 22:00 | 17 |
| 2022.08.13. 22:15 | 17 |
| 2022.08.13. 22:30 | 17 |
| 2022.08.13. 22:45 | 17 |
| 2022.08.13. 23:00 | 17 |
| 2022.08.13. 23:15 | 17 |
| 2022.08.13. 23:30 | 17 |
| 2022.08.13. 23:45 | 17 |
| 2022.08.14. 00:00 | 17 |
| 2022.08.14. 00:15 | 17 |
| 2022.08.14. 00:30 | 17 |
| 2022.08.14. 00:45 | 17 |
| 2022.08.14. 01:00 | 17 |
| 2022.08.14. 01:15 | 17 |
| 2022.08.14. 01:30 | 17 |
| 2022.08.14. 01:45 | 17 |
| 2022.08.14. 02:00 | 17 |
| 2022.08.14. 02:15 | 17 |
| 2022.08.14. 02:30 | 17 |
| 2022.08.14. 02:45 | 17 |
| 2022.08.14. 03:00 | 17 |
| 2022.08.14. 03:15 | 17 |
| 2022.08.14. 03:30 | 17 |
| 2022.08.14. 03:45 | 17 |
| 2022.08.14. 04:00 | 17 |
| 2022.08.14. 04:15 | 17 |
| 2022.08.14. 04:30 | 17 |
| 2022.08.14. 04:45 | 17 |
| 2022.08.14. 05:00 | 17 |
| 2022.08.14. 05:15 | 17 |
| 2022.08.14. 05:30 | 17 |
| 2022.08.14. 05:45 | 17 |
| 2022.08.14. 06:00 | 17 |
| 2022.08.14. 06:15 | 17 |
| 2022.08.14. 06:30 | 17 |
| 2022.08.14. 06:45 | 17 |
| 2022.08.14. 07:00 | 17 |
| 2022.08.14. 07:15 | 17 |
| 2022.08.14. 07:30 | 17 |
| 2022.08.14. 07:45 | 17 |
| 2022.08.14. 08:00 | 17 |
| 2022.08.14. 08:15 | 17 |
| 2022.08.14. 08:30 | 17 |
| 2022.08.14. 08:45 | 17 |
| 2022.08.14. 09:00 | 17 |
| 2022.08.14. 09:15 | 17 |
| 2022.08.14. 09:30 | 17 |
| 2022.08.14. 09:45 | 17 |
| 2022.08.14. 10:00 | 17 |
| 2022.08.14. 10:15 | 17 |
| 2022.08.14. 10:30 | 17 |
| 2022.08.14. 10:45 | 17 |
| 2022.08.14. 11:00 | 17 |
| 2022.08.14. 11:15 | 17 |
| 2022.08.14. 11:30 | 17 |
| 2022.08.14. 11:45 | 17 |
| 2022.08.14. 12:00 | 17 |
| 2022.08.14. 12:15 | 17 |
| 2022.08.14. 12:30 | 17 |
| 2022.08.14. 12:45 | 17 |
| 2022.08.14. 13:00 | 17 |
| 2022.08.14. 13:15 | 17 |
| 2022.08.14. 13:30 | 17 |
| 2022.08.14. 13:45 | 17 |
| 2022.08.14. 14:00 | 17 |
| 2022.08.14. 14:15 | 17 |
| 2022.08.14. 14:30 | 17 |
| 2022.08.14. 14:45 | 17 |
| 2022.08.14. 15:00 | 17 |
| 2022.08.14. 15:15 | 17 |
| 2022.08.14. 15:30 | 17 |
| 2022.08.14. 15:45 | 17 |
| 2022.08.14. 16:00 | 17 |
| 2022.08.14. 16:15 | 17 |
| 2022.08.14. 16:30 | 17 |
| 2022.08.14. 16:45 | 17 |
| 2022.08.14. 17:00 | 17 |
| 2022.08.14. 17:15 | 17 |
| 2022.08.14. 17:30 | 17 |
| 2022.08.14. 17:45 | 17 |
| 2022.08.14. 18:00 | 17 |
| 2022.08.14. 18:15 | 17 |
| 2022.08.14. 18:30 | 17 |
| 2022.08.14. 18:45 | 17 |
| 2022.08.14. 19:00 | 17 |
| 2022.08.14. 19:15 | 17 |
| 2022.08.14. 19:30 | 17 |
| 2022.08.14. 19:45 | 17 |
| 2022.08.14. 20:00 | 17 |
| 2022.08.14. 20:15 | 17 |
| 2022.08.14. 20:30 | 17 |
| 2022.08.14. 20:45 | 17 |
| 2022.08.14. 21:00 | 17 |
| 2022.08.14. 21:15 | 17 |
| 2022.08.14. 21:30 | 17 |
| 2022.08.14. 21:45 | 17 |
| 2022.08.14. 22:00 | 17 |
| 2022.08.14. 22:15 | 17 |
| 2022.08.14. 22:30 | 17 |
| 2022.08.14. 22:45 | 17 |
| 2022.08.14. 23:00 | 17 |
| 2022.08.14. 23:15 | 17 |
| 2022.08.14. 23:30 | 17 |
| 2022.08.14. 23:45 | 17 |
| 2022.08.15. 00:00 | 17 |
| 2022.08.15. 00:15 | 17 |
| 2022.08.15. 00:30 | 17 |
| 2022.08.15. 00:45 | 17 |
| 2022.08.15. 01:00 | 17 |
| 2022.08.15. 01:15 | 17 |
| 2022.08.15. 01:30 | 17 |
| 2022.08.15. 01:45 | 17 |
| 2022.08.15. 02:00 | 17 |
| 2022.08.15. 02:15 | 17 |
| 2022.08.15. 02:30 | 17 |
| 2022.08.15. 02:45 | 17 |
| 2022.08.15. 03:00 | 17 |
| 2022.08.15. 03:15 | 17 |
| 2022.08.15. 03:30 | 17 |
| 2022.08.15. 03:45 | 17 |
| 2022.08.15. 04:00 | 17 |
| 2022.08.15. 04:15 | 17 |
| 2022.08.15. 04:30 | 17 |
| 2022.08.15. 04:45 | 17 |
| 2022.08.15. 05:00 | 17 |
| 2022.08.15. 05:15 | 17 |
| 2022.08.15. 05:30 | 17 |
| 2022.08.15. 05:45 | 17 |
| 2022.08.15. 06:00 | 17 |
| 2022.08.15. 06:15 | 17 |
| 2022.08.15. 06:30 | 17 |
| 2022.08.15. 06:45 | 17 |
| 2022.08.15. 07:00 | 17 |
| 2022.08.15. 07:15 | 17 |
| 2022.08.15. 07:30 | 17 |
| 2022.08.15. 07:45 | 17 |
| 2022.08.15. 08:00 | 17 |
| 2022.08.15. 08:15 | 17 |
| 2022.08.15. 08:30 | 17 |
| 2022.08.15. 08:45 | 17 |
| 2022.08.15. 09:00 | 17 |
| 2022.08.15. 09:15 | 17 |
| 2022.08.15. 09:30 | 17 |
| 2022.08.15. 09:45 | 17 |
| 2022.08.15. 10:00 | 17 |
| 2022.08.15. 10:15 | 17 |
| 2022.08.15. 10:30 | 17 |
| 2022.08.15. 10:45 | 17 |
| 2022.08.15. 11:00 | 17 |
| 2022.08.15. 11:15 | 17 |
| 2022.08.15. 11:30 | 17 |
| 2022.08.15. 11:45 | 17 |
| 2022.08.15. 12:00 | 17 |
| 2022.08.15. 12:15 | 17 |
| 2022.08.15. 12:30 | 17 |
| 2022.08.15. 12:45 | 17 |
| 2022.08.15. 13:00 | 17 |
| 2022.08.15. 13:15 | 17 |
| 2022.08.15. 13:30 | 17 |
| 2022.08.15. 13:45 | 17 |
| 2022.08.15. 14:00 | 17 |
| 2022.08.15. 14:15 | 17 |
| 2022.08.15. 14:30 | 17 |
| 2022.08.15. 14:45 | 17 |
| 2022.08.15. 15:00 | 17 |
| 2022.08.15. 15:15 | 17 |
| 2022.08.15. 15:30 | 17 |
| 2022.08.15. 15:45 | 17 |
| 2022.08.15. 16:00 | 17 |
| 2022.08.15. 16:15 | 17 |
| 2022.08.15. 16:30 | 17 |
| 2022.08.15. 16:45 | 17 |
| 2022.08.15. 17:00 | 17 |
| 2022.08.15. 17:15 | 17 |
| 2022.08.15. 17:30 | 17 |
| 2022.08.15. 17:45 | 17 |
| 2022.08.15. 18:00 | 17 |
| 2022.08.15. 18:15 | 17 |
| 2022.08.15. 18:30 | 17 |
| 2022.08.15. 18:45 | 17 |
| 2022.08.15. 19:00 | 17 |
| 2022.08.15. 19:15 | 17 |
| 2022.08.15. 19:30 | 17 |
| 2022.08.15. 19:45 | 17 |
| 2022.08.15. 20:00 | 17 |
| 2022.08.15. 20:15 | 17 |
| 2022.08.15. 20:30 | 17 |
| 2022.08.15. 20:45 | 17 |
| 2022.08.15. 21:00 | 17 |
| 2022.08.15. 21:15 | 17 |
| 2022.08.15. 21:30 | 17 |
| 2022.08.15. 21:45 | 17 |
| 2022.08.15. 22:00 | 17 |
| 2022.08.15. 22:15 | 17 |
| 2022.08.15. 22:30 | 17 |
| 2022.08.15. 22:45 | 17 |
| 2022.08.15. 23:00 | 17 |
| 2022.08.15. 23:15 | 17 |
| 2022.08.15. 23:30 | 17 |
| 2022.08.15. 23:45 | 17 |
| 2022.08.16. 00:00 | 17 |
| 2022.08.16. 00:15 | 17 |
| 2022.08.16. 00:30 | 17 |
| 2022.08.16. 00:45 | 17 |
| 2022.08.16. 01:00 | 17 |
| 2022.08.16. 01:15 | 17 |
| 2022.08.16. 01:30 | 17 |
| 2022.08.16. 01:45 | 17 |
| 2022.08.16. 02:00 | 17 |
| 2022.08.16. 02:15 | 17 |
| 2022.08.16. 02:30 | 17 |
| 2022.08.16. 02:45 | 17 |
| 2022.08.16. 03:00 | 17 |
| 2022.08.16. 03:15 | 17 |
| 2022.08.16. 03:30 | 17 |
| 2022.08.16. 03:45 | 17 |
| 2022.08.16. 04:00 | 17 |
| 2022.08.16. 04:15 | 17 |
| 2022.08.16. 04:30 | 17 |
| 2022.08.16. 04:45 | 17 |
| 2022.08.16. 05:00 | 17 |
| 2022.08.16. 05:15 | 17 |
| 2022.08.16. 05:30 | 17 |
| 2022.08.16. 05:45 | 17 |
| 2022.08.16. 06:00 | 17 |
| 2022.08.16. 06:15 | 17 |
| 2022.08.16. 06:30 | 17 |
| 2022.08.16. 06:45 | 17 |
| 2022.08.16. 07:00 | 17 |
| 2022.08.16. 07:15 | 17 |
| 2022.08.16. 07:30 | 17 |
| 2022.08.16. 07:45 | 17 |
| 2022.08.16. 08:00 | 17 |
| 2022.08.16. 08:15 | 17 |
| 2022.08.16. 08:30 | 17 |
| 2022.08.16. 08:45 | 17 |
| 2022.08.16. 09:00 | 17 |
| 2022.08.16. 09:15 | 17 |
| 2022.08.16. 09:30 | 17 |
| 2022.08.16. 09:45 | 17 |
| 2022.08.16. 10:00 | 17 |
| 2022.08.16. 10:15 | 17 |
| 2022.08.16. 10:30 | 17 |
| 2022.08.16. 10:45 | 17 |
| 2022.08.16. 11:00 | 17 |
| 2022.08.16. 11:15 | 17 |
| 2022.08.16. 11:30 | 17 |
| 2022.08.16. 11:45 | 17 |
| 2022.08.16. 12:00 | 17 |
| 2022.08.16. 12:15 | 17 |
| 2022.08.16. 12:30 | 17 |
| 2022.08.16. 12:45 | 17 |
| 2022.08.16. 13:00 | 17 |
| 2022.08.16. 13:15 | 17 |
| 2022.08.16. 13:30 | 17 |
| 2022.08.16. 13:45 | 17 |
| 2022.08.16. 14:00 | 17 |
| 2022.08.16. 14:15 | 17 |
| 2022.08.16. 14:30 | 17 |
| 2022.08.16. 14:45 | 17 |
| 2022.08.16. 15:00 | 17 |
| 2022.08.16. 15:15 | 17 |
| 2022.08.16. 15:30 | 17 |
| 2022.08.16. 15:45 | 17 |
| 2022.08.16. 16:00 | 17 |
| 2022.08.16. 16:15 | 17 |
| 2022.08.16. 16:30 | 17 |
| 2022.08.16. 16:45 | 17 |
| 2022.08.16. 17:00 | 17 |
| 2022.08.16. 17:15 | 17 |
| 2022.08.16. 17:30 | 17 |
| 2022.08.16. 17:45 | 17 |
| 2022.08.16. 18:00 | 17 |
| 2022.08.16. 18:15 | 17 |
| 2022.08.16. 18:30 | 17 |
| 2022.08.16. 18:45 | 17 |
| 2022.08.16. 19:00 | 17 |
| 2022.08.16. 19:15 | 17 |
| 2022.08.16. 19:30 | 17 |
| 2022.08.16. 19:45 | 17 |
| 2022.08.16. 20:00 | 17 |
| 2022.08.16. 20:15 | 17 |
| 2022.08.16. 20:30 | 17 |
| 2022.08.16. 20:45 | 17 |
| 2022.08.16. 21:00 | 17 |
| 2022.08.16. 21:15 | 17 |
| 2022.08.16. 21:30 | 17 |
| 2022.08.16. 21:45 | 17 |
| 2022.08.16. 22:00 | 17 |
| 2022.08.16. 22:15 | 17 |
| 2022.08.16. 22:30 | 17 |
| 2022.08.16. 22:45 | 17 |
| 2022.08.16. 23:00 | 17 |
| 2022.08.16. 23:15 | 17 |
| 2022.08.16. 23:30 | 17 |
| 2022.08.16. 23:45 | 17 |
| 2022.08.17. 00:00 | 17 |
| 2022.08.17. 00:15 | 17 |
| 2022.08.17. 00:30 | 17 |
| 2022.08.17. 00:45 | 17 |
| 2022.08.17. 01:00 | 17 |
| 2022.08.17. 01:15 | 17 |
| 2022.08.17. 01:30 | 17 |
| 2022.08.17. 01:45 | 17 |
| 2022.08.17. 02:00 | 17 |
| 2022.08.17. 02:15 | 17 |
| 2022.08.17. 02:30 | 17 |
| 2022.08.17. 02:45 | 17 |
| 2022.08.17. 03:00 | 17 |
| 2022.08.17. 03:15 | 17 |
| 2022.08.17. 03:30 | 17 |
| 2022.08.17. 03:45 | 17 |
| 2022.08.17. 04:00 | 17 |
| 2022.08.17. 04:15 | 17 |
| 2022.08.17. 04:30 | 17 |
| 2022.08.17. 04:45 | 17 |
| 2022.08.17. 05:00 | 17 |
| 2022.08.17. 05:15 | 17 |
| 2022.08.17. 05:30 | 17 |
| 2022.08.17. 05:45 | 17 |
| 2022.08.17. 06:00 | 17 |
| 2022.08.17. 06:15 | 17 |
| 2022.08.17. 06:30 | 17 |
| 2022.08.17. 06:45 | 17 |
| 2022.08.17. 07:00 | 17 |
| 2022.08.17. 07:15 | 17 |
| 2022.08.17. 07:30 | 17 |
| 2022.08.17. 07:45 | 17 |
| 2022.08.17. 08:00 | 17 |
| 2022.08.17. 08:15 | 17 |
| 2022.08.17. 08:30 | 17 |
| 2022.08.17. 08:45 | 17 |
| 2022.08.17. 09:00 | 17 |
| 2022.08.17. 09:15 | 17 |
| 2022.08.17. 09:30 | 17 |
| 2022.08.17. 09:45 | 17 |
| 2022.08.17. 10:00 | 17 |
| 2022.08.17. 10:15 | 17 |
| 2022.08.17. 10:30 | 17 |
| 2022.08.17. 10:45 | 17 |
| 2022.08.17. 11:00 | 17 |
| 2022.08.17. 11:15 | 17 |
| 2022.08.17. 11:30 | 17 |
| 2022.08.17. 11:45 | 17 |
| 2022.08.17. 12:00 | 17 |
| 2022.08.17. 12:15 | 17 |
| 2022.08.17. 12:30 | 17 |
| 2022.08.17. 12:45 | 17 |
| 2022.08.17. 13:00 | 17 |
| 2022.08.17. 13:15 | 17 |
| 2022.08.17. 13:30 | 17 |
| 2022.08.17. 13:45 | 17 |
| 2022.08.17. 14:00 | 17 |
| 2022.08.17. 14:15 | 17 |
| 2022.08.17. 14:30 | 17 |
| 2022.08.17. 14:45 | 17 |
| 2022.08.17. 15:00 | 17 |
| 2022.08.17. 15:15 | 17 |
| 2022.08.17. 15:30 | 17 |
| 2022.08.17. 15:45 | 17 |
| 2022.08.17. 16:00 | 17 |
| 2022.08.17. 16:15 | 17 |
| 2022.08.17. 16:30 | 17 |
| 2022.08.17. 16:45 | 17 |
| 2022.08.17. 17:00 | 17 |
| 2022.08.17. 17:15 | 17 |
| 2022.08.17. 17:30 | 17 |
| 2022.08.17. 17:45 | 17 |
| 2022.08.17. 18:00 | 17 |
| 2022.08.17. 18:15 | 17 |
| 2022.08.17. 18:30 | 17 |
| 2022.08.17. 18:45 | 17 |
| 2022.08.17. 19:00 | 17 |
| 2022.08.17. 19:15 | 17 |
| 2022.08.17. 19:30 | 17 |
| 2022.08.17. 19:45 | 17 |
| 2022.08.17. 20:00 | 17 |
| 2022.08.17. 20:15 | 17 |
| 2022.08.17. 20:30 | 17 |
| 2022.08.17. 20:45 | 17 |
| 2022.08.17. 21:00 | 17 |
| 2022.08.17. 21:15 | 17 |
| 2022.08.17. 21:30 | 17 |
| 2022.08.17. 21:45 | 17 |
| 2022.08.17. 22:00 | 17 |
| 2022.08.17. 22:15 | 17 |
| 2022.08.17. 22:30 | 17 |
| 2022.08.17. 22:45 | 17 |
| 2022.08.17. 23:00 | 17 |
| 2022.08.17. 23:15 | 17 |
| 2022.08.17. 23:30 | 17 |
| 2022.08.17. 23:45 | 17 |
| 2022.08.18. 00:00 | 17 |
| 2022.08.18. 00:15 | 17 |
| 2022.08.18. 00:30 | 17 |
| 2022.08.18. 00:45 | 17 |
| 2022.08.18. 01:00 | 17 |
| 2022.08.18. 01:15 | 17 |
| 2022.08.18. 01:30 | 17 |
| 2022.08.18. 01:45 | 17 |
| 2022.08.18. 02:00 | 17 |
| 2022.08.18. 02:15 | 17 |
| 2022.08.18. 02:30 | 17 |
| 2022.08.18. 02:45 | 17 |
| 2022.08.18. 03:00 | 17 |
| 2022.08.18. 03:15 | 17 |
| 2022.08.18. 03:30 | 17 |
| 2022.08.18. 03:45 | 17 |
| 2022.08.18. 04:00 | 17 |
| 2022.08.18. 04:15 | 17 |
| 2022.08.18. 04:30 | 17 |
| 2022.08.18. 04:45 | 17 |
| 2022.08.18. 05:00 | 17 |
| 2022.08.18. 05:15 | 17 |
| 2022.08.18. 05:30 | 17 |
| 2022.08.18. 05:45 | 17 |
| 2022.08.18. 06:00 | 17 |
| 2022.08.18. 06:15 | 17 |
| 2022.08.18. 06:30 | 17 |
| 2022.08.18. 06:45 | 17 |
| 2022.08.18. 07:00 | 17 |
| 2022.08.18. 07:15 | 17 |
| 2022.08.18. 07:30 | 17 |
| 2022.08.18. 07:45 | 17 |
| 2022.08.18. 08:00 | 17 |
| 2022.08.18. 08:15 | 17 |
| 2022.08.18. 08:30 | 17 |
| 2022.08.18. 08:45 | 17 |
| 2022.08.18. 09:00 | 17 |
| 2022.08.18. 09:15 | 17 |
| 2022.08.18. 09:30 | 17 |
| 2022.08.18. 09:45 | 17 |
| 2022.08.18. 10:00 | 17 |
| 2022.08.18. 10:15 | 17 |
| 2022.08.18. 10:30 | 17 |
| 2022.08.18. 10:45 | 17 |
| 2022.08.18. 11:00 | 17 |
| 2022.08.18. 11:15 | 17 |
| 2022.08.18. 11:30 | 17 |
| 2022.08.18. 11:45 | 17 |
| 2022.08.18. 12:00 | 17 |
| 2022.08.18. 12:15 | 17 |
| 2022.08.18. 12:30 | 17 |
| 2022.08.18. 12:45 | 17 |
| 2022.08.18. 13:00 | 17 |
| 2022.08.18. 13:15 | 17 |
| 2022.08.18. 13:30 | 17 |
| 2022.08.18. 13:45 | 17 |
| 2022.08.18. 14:00 | 17 |
| 2022.08.18. 14:15 | 17 |
| 2022.08.18. 14:30 | 17 |
| 2022.08.18. 14:45 | 17 |
| 2022.08.18. 15:00 | 17 |
| 2022.08.18. 15:15 | 17 |
| 2022.08.18. 15:30 | 17 |
| 2022.08.18. 15:45 | 17 |
| 2022.08.18. 16:00 | 17 |
| 2022.08.18. 16:15 | 17 |
| 2022.08.18. 16:30 | 17 |
| 2022.08.18. 16:45 | 17 |
| 2022.08.18. 17:00 | 17 |
| 2022.08.18. 17:15 | 17 |
| 2022.08.18. 17:30 | 17 |
| 2022.08.18. 17:45 | 17 |
| 2022.08.18. 18:00 | 17 |
| 2022.08.18. 18:15 | 17 |
| 2022.08.18. 18:30 | 17 |
| 2022.08.18. 18:45 | 17 |
| 2022.08.18. 19:00 | 17 |
| 2022.08.18. 19:15 | 17 |
| 2022.08.18. 19:30 | 17 |
| 2022.08.18. 19:45 | 17 |
| 2022.08.18. 20:00 | 17 |
| 2022.08.18. 20:15 | 17 |
| 2022.08.18. 20:30 | 17 |
| 2022.08.18. 20:45 | 17 |
| 2022.08.18. 21:00 | 17 |
| 2022.08.18. 21:15 | 17 |
| 2022.08.18. 21:30 | 17 |
| 2022.08.18. 21:45 | 17 |
| 2022.08.18. 22:00 | 17 |
| 2022.08.18. 22:15 | 17 |
| 2022.08.18. 22:30 | 17 |
| 2022.08.18. 22:45 | 17 |
| 2022.08.18. 23:00 | 17 |
| 2022.08.18. 23:15 | 17 |
| 2022.08.18. 23:30 | 17 |
| 2022.08.18. 23:45 | 17 |
| 2022.08.19. 00:00 | 17 |
| 2022.08.19. 00:15 | 17 |
| 2022.08.19. 00:30 | 17 |
| 2022.08.19. 00:45 | 17 |
| 2022.08.19. 01:00 | 17 |
| 2022.08.19. 01:15 | 17 |
| 2022.08.19. 01:30 | 17 |
| 2022.08.19. 01:45 | 17 |
| 2022.08.19. 02:00 | 17 |
| 2022.08.19. 02:15 | 17 |
| 2022.08.19. 02:30 | 17 |
| 2022.08.19. 02:45 | 17 |
| 2022.08.19. 03:00 | 17 |
| 2022.08.19. 03:15 | 17 |
| 2022.08.19. 03:30 | 17 |
| 2022.08.19. 03:45 | 17 |
| 2022.08.19. 04:00 | 17 |
| 2022.08.19. 04:15 | 17 |
| 2022.08.19. 04:30 | 17 |
| 2022.08.19. 04:45 | 17 |
| 2022.08.19. 05:00 | 17 |
| 2022.08.19. 05:15 | 17 |
| 2022.08.19. 05:30 | 17 |
| 2022.08.19. 05:45 | 17 |
| 2022.08.19. 06:00 | 17 |
| 2022.08.19. 06:15 | 17 |
| 2022.08.19. 06:30 | 17 |
| 2022.08.19. 06:45 | 17 |
| 2022.08.19. 07:00 | 17 |
| 2022.08.19. 07:15 | 17 |
| 2022.08.19. 07:30 | 17 |
| 2022.08.19. 07:45 | 17 |
| 2022.08.19. 08:00 | 17 |
| 2022.08.19. 08:15 | 17 |
| 2022.08.19. 08:30 | 17 |
| 2022.08.19. 08:45 | 17 |
| 2022.08.19. 09:00 | 17 |
| 2022.08.19. 09:15 | 17 |
| 2022.08.19. 09:30 | 17 |
| 2022.08.19. 09:45 | 17 |
| 2022.08.19. 10:00 | 17 |
| 2022.08.19. 10:15 | 17 |
| 2022.08.19. 10:30 | 17 |
| 2022.08.19. 10:45 | 17 |
| 2022.08.19. 11:00 | 17 |
| 2022.08.19. 11:15 | 17 |
| 2022.08.19. 11:30 | 17 |
| 2022.08.19. 11:45 | 17 |
| 2022.08.19. 12:00 | 17 |
| 2022.08.19. 12:15 | 17 |
| 2022.08.19. 12:30 | 17 |
| 2022.08.19. 12:45 | 17 |
| 2022.08.19. 13:00 | 17 |
| 2022.08.19. 13:15 | 17 |
| 2022.08.19. 13:30 | 17 |
| 2022.08.19. 13:45 | 17 |
| 2022.08.19. 14:00 | 17 |
| 2022.08.19. 14:15 | 17 |
| 2022.08.19. 14:30 | 17 |
| 2022.08.19. 14:45 | 17 |
| 2022.08.19. 15:00 | 17 |
| 2022.08.19. 15:15 | 17 |
| 2022.08.19. 15:30 | 17 |
| 2022.08.19. 15:45 | 17 |
| 2022.08.19. 16:00 | 17 |
| 2022.08.19. 16:15 | 17 |
| 2022.08.19. 16:30 | 17 |
| 2022.08.19. 16:45 | 17 |
| 2022.08.19. 17:00 | 17 |
| 2022.08.19. 17:15 | 17 |
| 2022.08.19. 17:30 | 17 |
| 2022.08.19. 17:45 | 17 |
| 2022.08.19. 18:00 | 17 |
| 2022.08.19. 18:15 | 17 |
| 2022.08.19. 18:30 | 17 |
| 2022.08.19. 18:45 | 17 |
| 2022.08.19. 19:00 | 17 |
| 2022.08.19. 19:15 | 17 |
| 2022.08.19. 19:30 | 17 |
| 2022.08.19. 19:45 | 17 |
| 2022.08.19. 20:00 | 17 |
| 2022.08.19. 20:15 | 17 |
| 2022.08.19. 20:30 | 17 |
| 2022.08.19. 20:45 | 17 |
| 2022.08.19. 21:00 | 17 |
| 2022.08.19. 21:15 | 17 |
| 2022.08.19. 21:30 | 17 |
| 2022.08.19. 21:45 | 17 |
| 2022.08.19. 22:00 | 17 |
| 2022.08.19. 22:15 | 17 |
| 2022.08.19. 22:30 | 17 |
| 2022.08.19. 22:45 | 17 |
| 2022.08.19. 23:00 | 17 |
| 2022.08.19. 23:15 | 17 |
| 2022.08.19. 23:30 | 17 |
| 2022.08.19. 23:45 | 17 |
| 2022.08.20. 00:00 | 17 |
| 2022.08.20. 00:15 | 17 |
| 2022.08.20. 00:30 | 17 |
| 2022.08.20. 00:45 | 17 |
| 2022.08.20. 01:00 | 17 |
| 2022.08.20. 01:15 | 17 |
| 2022.08.20. 01:30 | 17 |
| 2022.08.20. 01:45 | 17 |
| 2022.08.20. 02:00 | 17 |
| 2022.08.20. 02:15 | 17 |
| 2022.08.20. 02:30 | 17 |
| 2022.08.20. 02:45 | 17 |
| 2022.08.20. 03:00 | 17 |
| 2022.08.20. 03:15 | 17 |
| 2022.08.20. 03:30 | 17 |
| 2022.08.20. 03:45 | 17 |
| 2022.08.20. 04:00 | 17 |
| 2022.08.20. 04:15 | 17 |
| 2022.08.20. 04:30 | 17 |
| 2022.08.20. 04:45 | 17 |
| 2022.08.20. 05:00 | 17 |
| 2022.08.20. 05:15 | 17 |
| 2022.08.20. 05:30 | 17 |
| 2022.08.20. 05:45 | 17 |
| 2022.08.20. 06:00 | 17 |
| 2022.08.20. 06:15 | 17 |
| 2022.08.20. 06:30 | 17 |
| 2022.08.20. 06:45 | 17 |
| 2022.08.20. 07:00 | 17 |
| 2022.08.20. 07:15 | 17 |
| 2022.08.20. 07:30 | 17 |
| 2022.08.20. 07:45 | 17 |
| 2022.08.20. 08:00 | 17 |
| 2022.08.20. 08:15 | 17 |
| 2022.08.20. 08:30 | 17 |
| 2022.08.20. 08:45 | 17 |
| 2022.08.20. 09:00 | 17 |
| 2022.08.20. 09:15 | 17 |
| 2022.08.20. 09:30 | 17 |
| 2022.08.20. 09:45 | 17 |
| 2022.08.20. 10:00 | 17 |
| 2022.08.20. 10:15 | 17 |
| 2022.08.20. 10:30 | 17 |
| 2022.08.20. 10:45 | 17 |
| 2022.08.20. 11:00 | 17 |
| 2022.08.20. 11:15 | 17 |
| 2022.08.20. 11:30 | 17 |
| 2022.08.20. 11:45 | 17 |
| 2022.08.20. 12:00 | 17 |
| 2022.08.20. 12:15 | 17 |
| 2022.08.20. 12:30 | 17 |
| 2022.08.20. 12:45 | 17 |
| 2022.08.20. 13:00 | 17 |
| 2022.08.20. 13:15 | 17 |
| 2022.08.20. 13:30 | 17 |
| 2022.08.20. 13:45 | 17 |
| 2022.08.20. 14:00 | 17 |
| 2022.08.20. 14:15 | 17 |
| 2022.08.20. 14:30 | 17 |
| 2022.08.20. 14:45 | 17 |
| 2022.08.20. 15:00 | 17 |
| 2022.08.20. 15:15 | 17 |
| 2022.08.20. 15:30 | 17 |
| 2022.08.20. 15:45 | 17 |
| 2022.08.20. 16:00 | 17 |
| 2022.08.20. 16:15 | 17 |
| 2022.08.20. 16:30 | 17 |
| 2022.08.20. 16:45 | 17 |
| 2022.08.20. 17:00 | 17 |
| 2022.08.20. 17:15 | 17 |
| 2022.08.20. 17:30 | 17 |
| 2022.08.20. 17:45 | 17 |
| 2022.08.20. 18:00 | 17 |
| 2022.08.20. 18:15 | 17 |
| 2022.08.20. 18:30 | 17 |
| 2022.08.20. 18:45 | 17 |
| 2022.08.20. 19:00 | 17 |
| 2022.08.20. 19:15 | 17 |
| 2022.08.20. 19:30 | 17 |
| 2022.08.20. 19:45 | 17 |
| 2022.08.20. 20:00 | 17 |
| 2022.08.20. 20:15 | 17 |
| 2022.08.20. 20:30 | 17 |
| 2022.08.20. 20:45 | 17 |
| 2022.08.20. 21:00 | 17 |
| 2022.08.20. 21:15 | 17 |
| 2022.08.20. 21:30 | 17 |
| 2022.08.20. 21:45 | 17 |
| 2022.08.20. 22:00 | 17 |
| 2022.08.20. 22:15 | 17 |
| 2022.08.20. 22:30 | 17 |
| 2022.08.20. 22:45 | 17 |
| 2022.08.20. 23:00 | 17 |
| 2022.08.20. 23:15 | 17 |
| 2022.08.20. 23:30 | 17 |
| 2022.08.20. 23:45 | 17 |
| 2022.08.21. 00:00 | 17 |
| 2022.08.21. 00:15 | 17 |
| 2022.08.21. 00:30 | 17 |
| 2022.08.21. 00:45 | 17 |
| 2022.08.21. 01:00 | 17 |
| 2022.08.21. 01:15 | 17 |
| 2022.08.21. 01:30 | 17 |
| 2022.08.21. 01:45 | 17 |
| 2022.08.21. 02:00 | 17 |
| 2022.08.21. 02:15 | 17 |
| 2022.08.21. 02:30 | 17 |
| 2022.08.21. 02:45 | 17 |
| 2022.08.21. 03:00 | 17 |
| 2022.08.21. 03:15 | 17 |
| 2022.08.21. 03:30 | 17 |
| 2022.08.21. 03:45 | 17 |
| 2022.08.21. 04:00 | 17 |
| 2022.08.21. 04:15 | 17 |
| 2022.08.21. 04:30 | 17 |
| 2022.08.21. 04:45 | 17 |
| 2022.08.21. 05:00 | 17 |
| 2022.08.21. 05:15 | 17 |
| 2022.08.21. 05:30 | 17 |
| 2022.08.21. 05:45 | 17 |
| 2022.08.21. 06:00 | 17 |
| 2022.08.21. 06:15 | 17 |
| 2022.08.21. 06:30 | 17 |
| 2022.08.21. 06:45 | 17 |
| 2022.08.21. 07:00 | 17 |
| 2022.08.21. 07:15 | 17 |
| 2022.08.21. 07:30 | 17 |
| 2022.08.21. 07:45 | 17 |
| 2022.08.21. 08:00 | 17 |
| 2022.08.21. 08:15 | 17 |
| 2022.08.21. 08:30 | 17 |
| 2022.08.21. 08:45 | 17 |
| 2022.08.21. 09:00 | 17 |
| 2022.08.21. 09:15 | 17 |
| 2022.08.21. 09:30 | 17 |
| 2022.08.21. 09:45 | 17 |
| 2022.08.21. 10:00 | 17 |
| 2022.08.21. 10:15 | 17 |
| 2022.08.21. 10:30 | 17 |
| 2022.08.21. 10:45 | 17 |
| 2022.08.21. 11:00 | 17 |
| 2022.08.21. 11:15 | 17 |
| 2022.08.21. 11:30 | 17 |
| 2022.08.21. 11:45 | 17 |
| 2022.08.21. 12:00 | 17 |
| 2022.08.21. 12:15 | 17 |
| 2022.08.21. 12:30 | 17 |
| 2022.08.21. 12:45 | 17 |
| 2022.08.21. 13:00 | 17 |
| 2022.08.21. 13:15 | 17 |
| 2022.08.21. 13:30 | 17 |
| 2022.08.21. 13:45 | 17 |
| 2022.08.21. 14:00 | 17 |
| 2022.08.21. 14:15 | 17 |
| 2022.08.21. 14:30 | 17 |
| 2022.08.21. 14:45 | 17 |
| 2022.08.21. 15:00 | 17 |
| 2022.08.21. 15:15 | 17 |
| 2022.08.21. 15:30 | 17 |
| 2022.08.21. 15:45 | 17 |
| 2022.08.21. 16:00 | 17 |
| 2022.08.21. 16:15 | 17 |
| 2022.08.21. 16:30 | 17 |
| 2022.08.21. 16:45 | 17 |
| 2022.08.21. 17:00 | 17 |
| 2022.08.21. 17:15 | 17 |
| 2022.08.21. 17:30 | 17 |
| 2022.08.21. 17:45 | 17 |
| 2022.08.21. 18:00 | 17 |
| 2022.08.21. 18:15 | 17 |
| 2022.08.21. 18:30 | 17 |
| 2022.08.21. 18:45 | 17 |
| 2022.08.21. 19:00 | 17 |
| 2022.08.21. 19:15 | 17 |
| 2022.08.21. 19:30 | 17 |
| 2022.08.21. 19:45 | 17 |
| 2022.08.21. 20:00 | 17 |
| 2022.08.21. 20:15 | 17 |
| 2022.08.21. 20:30 | 17 |
| 2022.08.21. 20:45 | 17 |
| 2022.08.21. 21:00 | 17 |
| 2022.08.21. 21:15 | 17 |
| 2022.08.21. 21:30 | 17 |
| 2022.08.21. 21:45 | 17 |
| 2022.08.21. 22:00 | 17 |
| 2022.08.21. 22:15 | 17 |
| 2022.08.21. 22:30 | 17 |
| 2022.08.21. 22:45 | 17 |
| 2022.08.21. 23:00 | 17 |
| 2022.08.21. 23:15 | 17 |
| 2022.08.21. 23:30 | 17 |
| 2022.08.21. 23:45 | 17 |
| 2022.08.22. 00:00 | 17 |
| 2022.08.22. 00:15 | 17 |
| 2022.08.22. 00:30 | 17 |
| 2022.08.22. 00:45 | 17 |
| 2022.08.22. 01:00 | 17 |
| 2022.08.22. 01:15 | 17 |
| 2022.08.22. 01:30 | 17 |
| 2022.08.22. 01:45 | 17 |
| 2022.08.22. 02:00 | 17 |
| 2022.08.22. 02:15 | 17 |
| 2022.08.22. 02:30 | 17 |
| 2022.08.22. 02:45 | 17 |
| 2022.08.22. 03:00 | 17 |
| 2022.08.22. 03:15 | 17 |
| 2022.08.22. 03:30 | 17 |
| 2022.08.22. 03:45 | 17 |
| 2022.08.22. 04:00 | 17 |
| 2022.08.22. 04:15 | 17 |
| 2022.08.22. 04:30 | 17 |
| 2022.08.22. 04:45 | 17 |
| 2022.08.22. 05:00 | 17 |
| 2022.08.22. 05:15 | 17 |
| 2022.08.22. 05:30 | 17 |
| 2022.08.22. 05:45 | 17 |
| 2022.08.22. 06:00 | 17 |
| 2022.08.22. 06:15 | 17 |
| 2022.08.22. 06:30 | 17 |
| 2022.08.22. 06:45 | 17 |
| 2022.08.22. 07:00 | 17 |
| 2022.08.22. 07:15 | 17 |
| 2022.08.22. 07:30 | 17 |
| 2022.08.22. 07:45 | 17 |
| 2022.08.22. 08:00 | 17 |
| 2022.08.22. 08:15 | 17 |
| 2022.08.22. 08:30 | 17 |
| 2022.08.22. 08:45 | 17 |
| 2022.08.22. 09:00 | 17 |
| 2022.08.22. 09:15 | 17 |
| 2022.08.22. 09:30 | 17 |
| 2022.08.22. 09:45 | 17 |
| 2022.08.22. 10:00 | 17 |
| 2022.08.22. 10:15 | 17 |
| 2022.08.22. 10:30 | 17 |
| 2022.08.22. 10:45 | 17 |
| 2022.08.22. 11:00 | 17 |
| 2022.08.22. 11:15 | 17 |
| 2022.08.22. 11:30 | 17 |
| 2022.08.22. 11:45 | 17 |
| 2022.08.22. 12:00 | 17 |
| 2022.08.22. 12:15 | 17 |
| 2022.08.22. 12:30 | 17 |
| 2022.08.22. 12:45 | 17 |
| 2022.08.22. 13:00 | 17 |
| 2022.08.22. 13:15 | 17 |
| 2022.08.22. 13:30 | 17 |
| 2022.08.22. 13:45 | 17 |
| 2022.08.22. 14:00 | 17 |
| 2022.08.22. 14:15 | 17 |
| 2022.08.22. 14:30 | 17 |
| 2022.08.22. 14:45 | 17 |
| 2022.08.22. 15:00 | 17 |
| 2022.08.22. 15:15 | 17 |
| 2022.08.22. 15:30 | 17 |
| 2022.08.22. 15:45 | 17 |
| 2022.08.22. 16:00 | 17 |
| 2022.08.22. 16:15 | 17 |
| 2022.08.22. 16:30 | 17 |
| 2022.08.22. 16:45 | 17 |
| 2022.08.22. 17:00 | 17 |
| 2022.08.22. 17:15 | 17 |
| 2022.08.22. 17:30 | 17 |
| 2022.08.22. 17:45 | 17 |
| 2022.08.22. 18:00 | 17 |
| 2022.08.22. 18:15 | 17 |
| 2022.08.22. 18:30 | 17 |
| 2022.08.22. 18:45 | 17 |
| 2022.08.22. 19:00 | 17 |
| 2022.08.22. 19:15 | 17 |
| 2022.08.22. 19:30 | 17 |
| 2022.08.22. 19:45 | 17 |
| 2022.08.22. 20:00 | 17 |
| 2022.08.22. 20:15 | 17 |
| 2022.08.22. 20:30 | 17 |
| 2022.08.22. 20:45 | 17 |
| 2022.08.22. 21:00 | 17 |
| 2022.08.22. 21:15 | 17 |
| 2022.08.22. 21:30 | 17 |
| 2022.08.22. 21:45 | 17 |
| 2022.08.22. 22:00 | 17 |
| 2022.08.22. 22:15 | 17 |
| 2022.08.22. 22:30 | 17 |
| 2022.08.22. 22:45 | 17 |
| 2022.08.22. 23:00 | 17 |
| 2022.08.22. 23:15 | 17 |
| 2022.08.22. 23:30 | 17 |
| 2022.08.22. 23:45 | 17 |
| 2022.08.23. 00:00 | 17 |
| 2022.08.23. 00:15 | 17 |
| 2022.08.23. 00:30 | 17 |
| 2022.08.23. 00:45 | 17 |
| 2022.08.23. 01:00 | 17 |
| 2022.08.23. 01:15 | 17 |
| 2022.08.23. 01:30 | 17 |
| 2022.08.23. 01:45 | 17 |
| 2022.08.23. 02:00 | 17 |
| 2022.08.23. 02:15 | 17 |
| 2022.08.23. 02:30 | 17 |
| 2022.08.23. 02:45 | 17 |
| 2022.08.23. 03:00 | 17 |
| 2022.08.23. 03:15 | 17 |
| 2022.08.23. 03:30 | 17 |
| 2022.08.23. 03:45 | 17 |
| 2022.08.23. 04:00 | 17 |
| 2022.08.23. 04:15 | 17 |
| 2022.08.23. 04:30 | 17 |
| 2022.08.23. 04:45 | 17 |
| 2022.08.23. 05:00 | 17 |
| 2022.08.23. 05:15 | 17 |
| 2022.08.23. 05:30 | 17 |
| 2022.08.23. 05:45 | 17 |
| 2022.08.23. 06:00 | 17 |
| 2022.08.23. 06:15 | 17 |
| 2022.08.23. 06:30 | 17 |
| 2022.08.23. 06:45 | 17 |
| 2022.08.23. 07:00 | 17 |
| 2022.08.23. 07:15 | 17 |
| 2022.08.23. 07:30 | 17 |
| 2022.08.23. 07:45 | 17 |
| 2022.08.23. 08:00 | 17 |
| 2022.08.23. 08:15 | 17 |
| 2022.08.23. 08:30 | 17 |
| 2022.08.23. 08:45 | 17 |
| 2022.08.23. 09:00 | 17 |
| 2022.08.23. 09:15 | 17 |
| 2022.08.23. 09:30 | 17 |
| 2022.08.23. 09:45 | 17 |
| 2022.08.23. 10:00 | 17 |
| 2022.08.23. 10:15 | 17 |
| 2022.08.23. 10:30 | 17 |
| 2022.08.23. 10:45 | 17 |
| 2022.08.23. 11:00 | 17 |
| 2022.08.23. 11:15 | 17 |
| 2022.08.23. 11:30 | 17 |
| 2022.08.23. 11:45 | 17 |
| 2022.08.23. 12:00 | 17 |
| 2022.08.23. 12:15 | 17 |
| 2022.08.23. 12:30 | 17 |
| 2022.08.23. 12:45 | 17 |
| 2022.08.23. 13:00 | 17 |
| 2022.08.23. 13:15 | 17 |
| 2022.08.23. 13:30 | 17 |
| 2022.08.23. 13:45 | 17 |
| 2022.08.23. 14:00 | 17 |
| 2022.08.23. 14:15 | 17 |
| 2022.08.23. 14:30 | 17 |
| 2022.08.23. 14:45 | 17 |
| 2022.08.23. 15:00 | 17 |
| 2022.08.23. 15:15 | 17 |
| 2022.08.23. 15:30 | 17 |
| 2022.08.23. 15:45 | 17 |
| 2022.08.23. 16:00 | 17 |
| 2022.08.23. 16:15 | 17 |
| 2022.08.23. 16:30 | 17 |
| 2022.08.23. 16:45 | 17 |
| 2022.08.23. 17:00 | 17 |
| 2022.08.23. 17:15 | 17 |
| 2022.08.23. 17:30 | 17 |
| 2022.08.23. 17:45 | 17 |
| 2022.08.23. 18:00 | 17 |
| 2022.08.23. 18:15 | 17 |
| 2022.08.23. 18:30 | 17 |
| 2022.08.23. 18:45 | 17 |
| 2022.08.23. 19:00 | 17 |
| 2022.08.23. 19:15 | 17 |
| 2022.08.23. 19:30 | 17 |
| 2022.08.23. 19:45 | 17 |
| 2022.08.23. 20:00 | 17 |
| 2022.08.23. 20:15 | 17 |
| 2022.08.23. 20:30 | 17 |
| 2022.08.23. 20:45 | 17 |
| 2022.08.23. 21:00 | 17 |
| 2022.08.23. 21:15 | 17 |
| 2022.08.23. 21:30 | 17 |
| 2022.08.23. 21:45 | 17 |
| 2022.08.23. 22:00 | 17 |
| 2022.08.23. 22:15 | 17 |
| 2022.08.23. 22:30 | 17 |
| 2022.08.23. 22:45 | 17 |
| 2022.08.23. 23:00 | 17 |
| 2022.08.23. 23:15 | 17 |
| 2022.08.23. 23:30 | 17 |
| 2022.08.23. 23:45 | 17 |
| 2022.08.24. 00:00 | 17 |
| 2022.08.24. 00:15 | 17 |
| 2022.08.24. 00:30 | 17 |
| 2022.08.24. 00:45 | 17 |
| 2022.08.24. 01:00 | 17 |
| 2022.08.24. 01:15 | 17 |
| 2022.08.24. 01:30 | 17 |
| 2022.08.24. 01:45 | 17 |
| 2022.08.24. 02:00 | 17 |
| 2022.08.24. 02:15 | 17 |
| 2022.08.24. 02:30 | 17 |
| 2022.08.24. 02:45 | 17 |
| 2022.08.24. 03:00 | 17 |
| 2022.08.24. 03:15 | 17 |
| 2022.08.24. 03:30 | 17 |
| 2022.08.24. 03:45 | 17 |
| 2022.08.24. 04:00 | 17 |
| 2022.08.24. 04:15 | 17 |
| 2022.08.24. 04:30 | 17 |
| 2022.08.24. 04:45 | 17 |
| 2022.08.24. 05:00 | 17 |
| 2022.08.24. 05:15 | 17 |
| 2022.08.24. 05:30 | 17 |
| 2022.08.24. 05:45 | 17 |
| 2022.08.24. 06:00 | 17 |
| 2022.08.24. 06:15 | 17 |
| 2022.08.24. 06:30 | 17 |
| 2022.08.24. 06:45 | 17 |
| 2022.08.24. 07:00 | 17 |
| 2022.08.24. 07:15 | 17 |
| 2022.08.24. 07:30 | 17 |
| 2022.08.24. 07:45 | 17 |
| 2022.08.24. 08:00 | 17 |
| 2022.08.24. 08:15 | 17 |
| 2022.08.24. 08:30 | 17 |
| 2022.08.24. 08:45 | 17 |
| 2022.08.24. 09:00 | 17 |
| 2022.08.24. 09:15 | 17 |
| 2022.08.24. 09:30 | 17 |
| 2022.08.24. 09:45 | 17 |
| 2022.08.24. 10:00 | 17 |
| 2022.08.24. 10:15 | 17 |
| 2022.08.24. 10:30 | 17 |
| 2022.08.24. 10:45 | 17 |
| 2022.08.24. 11:00 | 17 |
| 2022.08.24. 11:15 | 17 |
| 2022.08.24. 11:30 | 17 |
| 2022.08.24. 11:45 | 17 |
| 2022.08.24. 12:00 | 17 |
| 2022.08.24. 12:15 | 17 |
| 2022.08.24. 12:30 | 17 |
| 2022.08.24. 12:45 | 17 |
| 2022.08.24. 13:00 | 17 |
| 2022.08.24. 13:15 | 17 |
| 2022.08.24. 13:30 | 17 |
| 2022.08.24. 13:45 | 17 |
| 2022.08.24. 14:00 | 17 |
| 2022.08.24. 14:15 | 17 |
| 2022.08.24. 14:30 | 17 |
| 2022.08.24. 14:45 | 17 |
| 2022.08.24. 15:00 | 17 |
| 2022.08.24. 15:15 | 17 |
| 2022.08.24. 15:30 | 17 |
| 2022.08.24. 15:45 | 17 |
| 2022.08.24. 16:00 | 17 |
| 2022.08.24. 16:15 | 17 |
| 2022.08.24. 16:30 | 17 |
| 2022.08.24. 16:45 | 17 |
| 2022.08.24. 17:00 | 17 |
| 2022.08.24. 17:15 | 17 |
| 2022.08.24. 17:30 | 17 |
| 2022.08.24. 17:45 | 17 |
| 2022.08.24. 18:00 | 17 |
| 2022.08.24. 18:15 | 17 |
| 2022.08.24. 18:30 | 17 |
| 2022.08.24. 18:45 | 17 |
| 2022.08.24. 19:00 | 17 |
| 2022.08.24. 19:15 | 17 |
| 2022.08.24. 19:30 | 17 |
| 2022.08.24. 19:45 | 17 |
| 2022.08.24. 20:00 | 17 |
| 2022.08.24. 20:15 | 17 |
| 2022.08.24. 20:30 | 17 |
| 2022.08.24. 20:45 | 17 |
| 2022.08.24. 21:00 | 17 |
| 2022.08.24. 21:15 | 17 |
| 2022.08.24. 21:30 | 17 |
| 2022.08.24. 21:45 | 17 |
| 2022.08.24. 22:00 | 17 |
| 2022.08.24. 22:15 | 17 |
| 2022.08.24. 22:30 | 17 |
| 2022.08.24. 22:45 | 17 |
| 2022.08.24. 23:00 | 17 |
| 2022.08.24. 23:15 | 17 |
| 2022.08.24. 23:30 | 17 |
| 2022.08.24. 23:45 | 17 |
| 2022.08.25. 00:00 | 17 |
| 2022.08.25. 00:15 | 17 |
| 2022.08.25. 00:30 | 17 |
| 2022.08.25. 00:45 | 17 |
| 2022.08.25. 01:00 | 17 |
| 2022.08.25. 01:15 | 17 |
| 2022.08.25. 01:30 | 17 |
| 2022.08.25. 01:45 | 17 |
| 2022.08.25. 02:00 | 17 |
| 2022.08.25. 02:15 | 17 |
| 2022.08.25. 02:30 | 17 |
| 2022.08.25. 02:45 | 17 |
| 2022.08.25. 03:00 | 17 |
| 2022.08.25. 03:15 | 17 |
| 2022.08.25. 03:30 | 17 |
| 2022.08.25. 03:45 | 17 |
| 2022.08.25. 04:00 | 17 |
| 2022.08.25. 04:15 | 17 |
| 2022.08.25. 04:30 | 17 |
| 2022.08.25. 04:45 | 17 |
| 2022.08.25. 05:00 | 17 |
| 2022.08.25. 05:15 | 17 |
| 2022.08.25. 05:30 | 17 |
| 2022.08.25. 05:45 | 17 |
| 2022.08.25. 06:00 | 17 |
| 2022.08.25. 06:15 | 17 |
| 2022.08.25. 06:30 | 17 |
| 2022.08.25. 06:45 | 17 |
| 2022.08.25. 07:00 | 17 |
| 2022.08.25. 07:15 | 17 |
| 2022.08.25. 07:30 | 17 |
| 2022.08.25. 07:45 | 17 |
| 2022.08.25. 08:00 | 17 |
| 2022.08.25. 08:15 | 17 |
| 2022.08.25. 08:30 | 17 |
| 2022.08.25. 08:45 | 17 |
| 2022.08.25. 09:00 | 17 |
| 2022.08.25. 09:15 | 17 |
| 2022.08.25. 09:30 | 17 |
| 2022.08.25. 09:45 | 17 |
| 2022.08.25. 10:00 | 17 |
| 2022.08.25. 10:15 | 17 |
| 2022.08.25. 10:30 | 17 |
| 2022.08.25. 10:45 | 17 |
| 2022.08.25. 11:00 | 17 |
| 2022.08.25. 11:15 | 17 |
| 2022.08.25. 11:30 | 17 |
| 2022.08.25. 11:45 | 17 |
| 2022.08.25. 12:00 | 17 |
| 2022.08.25. 12:15 | 17 |
| 2022.08.25. 12:30 | 17 |
| 2022.08.25. 12:45 | 17 |
| 2022.08.25. 13:00 | 17 |
| 2022.08.25. 13:15 | 17 |
| 2022.08.25. 13:30 | 17 |
| 2022.08.25. 13:45 | 17 |
| 2022.08.25. 14:00 | 17 |
| 2022.08.25. 14:15 | 17 |
| 2022.08.25. 14:30 | 17 |
| 2022.08.25. 14:45 | 17 |
| 2022.08.25. 15:00 | 17 |
| 2022.08.25. 15:15 | 17 |
| 2022.08.25. 15:30 | 17 |
| 2022.08.25. 15:45 | 17 |
| 2022.08.25. 16:00 | 17 |
| 2022.08.25. 16:15 | 17 |
| 2022.08.25. 16:30 | 17 |
| 2022.08.25. 16:45 | 17 |
| 2022.08.25. 17:00 | 17 |
| 2022.08.25. 17:15 | 17 |
| 2022.08.25. 17:30 | 17 |
| 2022.08.25. 17:45 | 17 |
| 2022.08.25. 18:00 | 17 |
| 2022.08.25. 18:15 | 17 |
| 2022.08.25. 18:30 | 17 |
| 2022.08.25. 18:45 | 17 |
| 2022.08.25. 19:00 | 17 |
| 2022.08.25. 19:15 | 17 |
| 2022.08.25. 19:30 | 17 |
| 2022.08.25. 19:45 | 17 |
| 2022.08.25. 20:00 | 17 |
| 2022.08.25. 20:15 | 17 |
| 2022.08.25. 20:30 | 17 |
| 2022.08.25. 20:45 | 17 |
| 2022.08.25. 21:00 | 17 |
| 2022.08.25. 21:15 | 17 |
| 2022.08.25. 21:30 | 17 |
| 2022.08.25. 21:45 | 17 |
| 2022.08.25. 22:00 | 17 |
| 2022.08.25. 22:15 | 17 |
| 2022.08.25. 22:30 | 17 |
| 2022.08.25. 22:45 | 17 |
| 2022.08.25. 23:00 | 17 |
| 2022.08.25. 23:15 | 17 |
| 2022.08.25. 23:30 | 17 |
| 2022.08.25. 23:45 | 17 |
| 2022.08.26. 00:00 | 17 |
| 2022.08.26. 00:15 | 17 |
| 2022.08.26. 00:30 | 17 |
| 2022.08.26. 00:45 | 17 |
| 2022.08.26. 01:00 | 17 |
| 2022.08.26. 01:15 | 17 |
| 2022.08.26. 01:30 | 17 |
| 2022.08.26. 01:45 | 17 |
| 2022.08.26. 02:00 | 17 |
| 2022.08.26. 02:15 | 17 |
| 2022.08.26. 02:30 | 17 |
| 2022.08.26. 02:45 | 17 |
| 2022.08.26. 03:00 | 17 |
| 2022.08.26. 03:15 | 17 |
| 2022.08.26. 03:30 | 17 |
| 2022.08.26. 03:45 | 17 |
| 2022.08.26. 04:00 | 17 |
| 2022.08.26. 04:15 | 17 |
| 2022.08.26. 04:30 | 17 |
| 2022.08.26. 04:45 | 17 |
| 2022.08.26. 05:00 | 17 |
| 2022.08.26. 05:15 | 17 |
| 2022.08.26. 05:30 | 17 |
| 2022.08.26. 05:45 | 17 |
| 2022.08.26. 06:00 | 17 |
| 2022.08.26. 06:15 | 17 |
| 2022.08.26. 06:30 | 17 |
| 2022.08.26. 06:45 | 17 |
| 2022.08.26. 07:00 | 17 |
| 2022.08.26. 07:15 | 17 |
| 2022.08.26. 07:30 | 17 |
| 2022.08.26. 07:45 | 17 |
| 2022.08.26. 08:00 | 17 |
| 2022.08.26. 08:15 | 17 |
| 2022.08.26. 08:30 | 17 |
| 2022.08.26. 08:45 | 17 |
| 2022.08.26. 09:00 | 17 |
| 2022.08.26. 09:15 | 17 |
| 2022.08.26. 09:30 | 17 |
| 2022.08.26. 09:45 | 17 |
| 2022.08.26. 10:00 | 17 |
| 2022.08.26. 10:15 | 17 |
| 2022.08.26. 10:30 | 17 |
| 2022.08.26. 10:45 | 17 |
| 2022.08.26. 11:00 | 17 |
| 2022.08.26. 11:15 | 17 |
| 2022.08.26. 11:30 | 17 |
| 2022.08.26. 11:45 | 17 |
| 2022.08.26. 12:00 | 17 |
| 2022.08.26. 12:15 | 17 |
| 2022.08.26. 12:30 | 17 |
| 2022.08.26. 12:45 | 17 |
| 2022.08.26. 13:00 | 17 |
| 2022.08.26. 13:15 | 17 |
| 2022.08.26. 13:30 | 17 |
| 2022.08.26. 13:45 | 17 |
| 2022.08.26. 14:00 | 17 |
| 2022.08.26. 14:15 | 17 |
| 2022.08.26. 14:30 | 17 |
| 2022.08.26. 14:45 | 17 |
| 2022.08.26. 15:00 | 17 |
| 2022.08.26. 15:15 | 17 |
| 2022.08.26. 15:30 | 17 |
| 2022.08.26. 15:45 | 17 |
| 2022.08.26. 16:00 | 17 |
| 2022.08.26. 16:15 | 17 |
| 2022.08.26. 16:30 | 17 |
| 2022.08.26. 16:45 | 17 |
| 2022.08.26. 17:00 | 17 |
| 2022.08.26. 17:15 | 17 |
| 2022.08.26. 17:30 | 17 |
| 2022.08.26. 17:45 | 17 |
| 2022.08.26. 18:00 | 17 |
| 2022.08.26. 18:15 | 17 |
| 2022.08.26. 18:30 | 17 |
| 2022.08.26. 18:45 | 17 |
| 2022.08.26. 19:00 | 17 |
| 2022.08.26. 19:15 | 17 |
| 2022.08.26. 19:30 | 17 |
| 2022.08.26. 19:45 | 17 |
| 2022.08.26. 20:00 | 17 |
| 2022.08.26. 20:15 | 17 |
| 2022.08.26. 20:30 | 17 |
| 2022.08.26. 20:45 | 17 |
| 2022.08.26. 21:00 | 17 |
| 2022.08.26. 21:15 | 17 |
| 2022.08.26. 21:30 | 17 |
| 2022.08.26. 21:45 | 17 |
| 2022.08.26. 22:00 | 17 |
| 2022.08.26. 22:15 | 17 |
| 2022.08.26. 22:30 | 17 |
| 2022.08.26. 22:45 | 17 |
| 2022.08.26. 23:00 | 17 |
| 2022.08.26. 23:15 | 17 |
| 2022.08.26. 23:30 | 17 |
| 2022.08.26. 23:45 | 17 |
| 2022.08.27. 00:00 | 17 |
| 2022.08.27. 00:15 | 17 |
| 2022.08.27. 00:30 | 17 |
| 2022.08.27. 00:45 | 17 |
| 2022.08.27. 01:00 | 17 |
| 2022.08.27. 01:15 | 17 |
| 2022.08.27. 01:30 | 17 |
| 2022.08.27. 01:45 | 17 |
| 2022.08.27. 02:00 | 17 |
| 2022.08.27. 02:15 | 17 |
| 2022.08.27. 02:30 | 17 |
| 2022.08.27. 02:45 | 17 |
| 2022.08.27. 03:00 | 17 |
| 2022.08.27. 03:15 | 17 |
| 2022.08.27. 03:30 | 17 |
| 2022.08.27. 03:45 | 17 |
| 2022.08.27. 04:00 | 17 |
| 2022.08.27. 04:15 | 17 |
| 2022.08.27. 04:30 | 17 |
| 2022.08.27. 04:45 | 17 |
| 2022.08.27. 05:00 | 17 |
| 2022.08.27. 05:15 | 17 |
| 2022.08.27. 05:30 | 17 |
| 2022.08.27. 05:45 | 17 |
| 2022.08.27. 06:00 | 17 |
| 2022.08.27. 06:15 | 17 |
| 2022.08.27. 06:30 | 17 |
| 2022.08.27. 06:45 | 17 |
| 2022.08.27. 07:00 | 17 |
| 2022.08.27. 07:15 | 17 |
| 2022.08.27. 07:30 | 17 |
| 2022.08.27. 07:45 | 17 |
| 2022.08.27. 08:00 | 17 |
| 2022.08.27. 08:15 | 17 |
| 2022.08.27. 08:30 | 17 |
| 2022.08.27. 08:45 | 17 |
| 2022.08.27. 09:00 | 17 |
| 2022.08.27. 09:15 | 17 |
| 2022.08.27. 09:30 | 17 |
| 2022.08.27. 09:45 | 17 |
| 2022.08.27. 10:00 | 17 |
| 2022.08.27. 10:15 | 17 |
| 2022.08.27. 10:30 | 17 |
| 2022.08.27. 10:45 | 17 |
| 2022.08.27. 11:00 | 17 |
| 2022.08.27. 11:15 | 17 |
| 2022.08.27. 11:30 | 17 |
| 2022.08.27. 11:45 | 17 |
| 2022.08.27. 12:00 | 17 |
| 2022.08.27. 12:15 | 17 |
| 2022.08.27. 12:30 | 17 |
| 2022.08.27. 12:45 | 17 |
| 2022.08.27. 13:00 | 17 |
| 2022.08.27. 13:15 | 17 |
| 2022.08.27. 13:30 | 17 |
| 2022.08.27. 13:45 | 17 |
| 2022.08.27. 14:00 | 17 |
| 2022.08.27. 14:15 | 17 |
| 2022.08.27. 14:30 | 17 |
| 2022.08.27. 14:45 | 17 |
| 2022.08.27. 15:00 | 17 |
| 2022.08.27. 15:15 | 17 |
| 2022.08.27. 15:30 | 17 |
| 2022.08.27. 15:45 | 17 |
| 2022.08.27. 16:00 | 17 |
| 2022.08.27. 16:15 | 17 |
| 2022.08.27. 16:30 | 17 |
| 2022.08.27. 16:45 | 17 |
| 2022.08.27. 17:00 | 17 |
| 2022.08.27. 17:15 | 17 |
| 2022.08.27. 17:30 | 17 |
| 2022.08.27. 17:45 | 17 |
| 2022.08.27. 18:00 | 17 |
| 2022.08.27. 18:15 | 17 |
| 2022.08.27. 18:30 | 17 |
| 2022.08.27. 18:45 | 17 |
| 2022.08.27. 19:00 | 17 |
| 2022.08.27. 19:15 | 17 |
| 2022.08.27. 19:30 | 17 |
| 2022.08.27. 19:45 | 17 |
| 2022.08.27. 20:00 | 17 |
| 2022.08.27. 20:15 | 17 |
| 2022.08.27. 20:30 | 17 |
| 2022.08.27. 20:45 | 17 |
| 2022.08.27. 21:00 | 17 |
| 2022.08.27. 21:15 | 17 |
| 2022.08.27. 21:30 | 17 |
| 2022.08.27. 21:45 | 17 |
| 2022.08.27. 22:00 | 17 |
| 2022.08.27. 22:15 | 17 |
| 2022.08.27. 22:30 | 17 |
| 2022.08.27. 22:45 | 17 |
| 2022.08.27. 23:00 | 17 |
| 2022.08.27. 23:15 | 17 |
| 2022.08.27. 23:30 | 17 |
| 2022.08.27. 23:45 | 17 |
| 2022.08.28. 00:00 | 17 |
| 2022.08.28. 00:15 | 17 |
| 2022.08.28. 00:30 | 17 |
| 2022.08.28. 00:45 | 17 |
| 2022.08.28. 01:00 | 17 |
| 2022.08.28. 01:15 | 17 |
| 2022.08.28. 01:30 | 17 |
| 2022.08.28. 01:45 | 17 |
| 2022.08.28. 02:00 | 17 |
| 2022.08.28. 02:15 | 17 |
| 2022.08.28. 02:30 | 17 |
| 2022.08.28. 02:45 | 17 |
| 2022.08.28. 03:00 | 17 |
| 2022.08.28. 03:15 | 17 |
| 2022.08.28. 03:30 | 17 |
| 2022.08.28. 03:45 | 17 |
| 2022.08.28. 04:00 | 17 |
| 2022.08.28. 04:15 | 17 |
| 2022.08.28. 04:30 | 17 |
| 2022.08.28. 04:45 | 17 |
| 2022.08.28. 05:00 | 17 |
| 2022.08.28. 05:15 | 17 |
| 2022.08.28. 05:30 | 17 |
| 2022.08.28. 05:45 | 17 |
| 2022.08.28. 06:00 | 17 |
| 2022.08.28. 06:15 | 17 |
| 2022.08.28. 06:30 | 17 |
| 2022.08.28. 06:45 | 17 |
| 2022.08.28. 07:00 | 17 |
| 2022.08.28. 07:15 | 17 |
| 2022.08.28. 07:30 | 17 |
| 2022.08.28. 07:45 | 17 |
| 2022.08.28. 08:00 | 17 |
| 2022.08.28. 08:15 | 17 |
| 2022.08.28. 08:30 | 17 |
| 2022.08.28. 08:45 | 17 |
| 2022.08.28. 09:00 | 17 |
| 2022.08.28. 09:15 | 17 |
| 2022.08.28. 09:30 | 17 |
| 2022.08.28. 09:45 | 17 |
| 2022.08.28. 10:00 | 17 |
| 2022.08.28. 10:15 | 17 |
| 2022.08.28. 10:30 | 17 |
| 2022.08.28. 10:45 | 17 |
| 2022.08.28. 11:00 | 17 |
| 2022.08.28. 11:15 | 17 |
| 2022.08.28. 11:30 | 17 |
| 2022.08.28. 11:45 | 17 |
| 2022.08.28. 12:00 | 17 |
| 2022.08.28. 12:15 | 17 |
| 2022.08.28. 12:30 | 17 |
| 2022.08.28. 12:45 | 17 |
| 2022.08.28. 13:00 | 17 |
| 2022.08.28. 13:15 | 17 |
| 2022.08.28. 13:30 | 17 |
| 2022.08.28. 13:45 | 17 |
| 2022.08.28. 14:00 | 17 |
| 2022.08.28. 14:15 | 17 |
| 2022.08.28. 14:30 | 17 |
| 2022.08.28. 14:45 | 17 |
| 2022.08.28. 15:00 | 17 |
| 2022.08.28. 15:15 | 17 |
| 2022.08.28. 15:30 | 17 |
| 2022.08.28. 15:45 | 17 |
| 2022.08.28. 16:00 | 17 |
| 2022.08.28. 16:15 | 17 |
| 2022.08.28. 16:30 | 17 |
| 2022.08.28. 16:45 | 17 |
| 2022.08.28. 17:00 | 17 |
| 2022.08.28. 17:15 | 17 |
| 2022.08.28. 17:30 | 17 |
| 2022.08.28. 17:45 | 17 |
| 2022.08.28. 18:00 | 17 |
| 2022.08.28. 18:15 | 17 |
| 2022.08.28. 18:30 | 17 |
| 2022.08.28. 18:45 | 17 |
| 2022.08.28. 19:00 | 17 |
| 2022.08.28. 19:15 | 17 |
| 2022.08.28. 19:30 | 17 |
| 2022.08.28. 19:45 | 17 |
| 2022.08.28. 20:00 | 17 |
| 2022.08.28. 20:15 | 17 |
| 2022.08.28. 20:30 | 17 |
| 2022.08.28. 20:45 | 17 |
| 2022.08.28. 21:00 | 17 |
| 2022.08.28. 21:15 | 17 |
| 2022.08.28. 21:30 | 17 |
| 2022.08.28. 21:45 | 17 |
| 2022.08.28. 22:00 | 17 |
| 2022.08.28. 22:15 | 17 |
| 2022.08.28. 22:30 | 17 |
| 2022.08.28. 22:45 | 17 |
| 2022.08.28. 23:00 | 17 |
| 2022.08.28. 23:15 | 17 |
| 2022.08.28. 23:30 | 17 |
| 2022.08.28. 23:45 | 17 |
| 2022.08.29. 00:00 | 17 |
| 2022.08.29. 00:15 | 17 |
| 2022.08.29. 00:30 | 17 |
| 2022.08.29. 00:45 | 17 |
| 2022.08.29. 01:00 | 17 |
| 2022.08.29. 01:15 | 17 |
| 2022.08.29. 01:30 | 17 |
| 2022.08.29. 01:45 | 17 |
| 2022.08.29. 02:00 | 17 |
| 2022.08.29. 02:15 | 17 |
| 2022.08.29. 02:30 | 17 |
| 2022.08.29. 02:45 | 17 |
| 2022.08.29. 03:00 | 17 |
| 2022.08.29. 03:15 | 17 |
| 2022.08.29. 03:30 | 17 |
| 2022.08.29. 03:45 | 17 |
| 2022.08.29. 04:00 | 17 |
| 2022.08.29. 04:15 | 17 |
| 2022.08.29. 04:30 | 17 |
| 2022.08.29. 04:45 | 17 |
| 2022.08.29. 05:00 | 17 |
| 2022.08.29. 05:15 | 17 |
| 2022.08.29. 05:30 | 17 |
| 2022.08.29. 05:45 | 17 |
| 2022.08.29. 06:00 | 17 |
| 2022.08.29. 06:15 | 17 |
| 2022.08.29. 06:30 | 17 |
| 2022.08.29. 06:45 | 17 |
| 2022.08.29. 07:00 | 17 |
| 2022.08.29. 07:15 | 17 |
| 2022.08.29. 07:30 | 17 |
| 2022.08.29. 07:45 | 17 |
| 2022.08.29. 08:00 | 17 |
| 2022.08.29. 08:15 | 17 |
| 2022.08.29. 08:30 | 17 |
| 2022.08.29. 08:45 | 17 |
| 2022.08.29. 09:00 | 17 |
| 2022.08.29. 09:15 | 17 |
| 2022.08.29. 09:30 | 17 |
| 2022.08.29. 09:45 | 17 |
| 2022.08.29. 10:00 | 17 |
| 2022.08.29. 10:15 | 17 |
| 2022.08.29. 10:30 | 17 |
| 2022.08.29. 10:45 | 17 |
| 2022.08.29. 11:00 | 17 |
| 2022.08.29. 11:15 | 17 |
| 2022.08.29. 11:30 | 17 |
| 2022.08.29. 11:45 | 17 |
| 2022.08.29. 12:00 | 17 |
| 2022.08.29. 12:15 | 17 |
| 2022.08.29. 12:30 | 17 |
| 2022.08.29. 12:45 | 17 |
| 2022.08.29. 13:00 | 17 |
| 2022.08.29. 13:15 | 17 |
| 2022.08.29. 13:30 | 17 |
| 2022.08.29. 13:45 | 17 |
| 2022.08.29. 14:00 | 17 |
| 2022.08.29. 14:15 | 17 |
| 2022.08.29. 14:30 | 17 |
| 2022.08.29. 14:45 | 17 |
| 2022.08.29. 15:00 | 17 |
| 2022.08.29. 15:15 | 17 |
| 2022.08.29. 15:30 | 17 |
| 2022.08.29. 15:45 | 17 |
| 2022.08.29. 16:00 | 17 |
| 2022.08.29. 16:15 | 17 |
| 2022.08.29. 16:30 | 17 |
| 2022.08.29. 16:45 | 17 |
| 2022.08.29. 17:00 | 17 |
| 2022.08.29. 17:15 | 17 |
| 2022.08.29. 17:30 | 17 |
| 2022.08.29. 17:45 | 17 |
| 2022.08.29. 18:00 | 17 |
| 2022.08.29. 18:15 | 17 |
| 2022.08.29. 18:30 | 17 |
| 2022.08.29. 18:45 | 17 |
| 2022.08.29. 19:00 | 17 |
| 2022.08.29. 19:15 | 17 |
| 2022.08.29. 19:30 | 17 |
| 2022.08.29. 19:45 | 17 |
| 2022.08.29. 20:00 | 17 |
| 2022.08.29. 20:15 | 17 |
| 2022.08.29. 20:30 | 17 |
| 2022.08.29. 20:45 | 17 |
| 2022.08.29. 21:00 | 17 |
| 2022.08.29. 21:15 | 17 |
| 2022.08.29. 21:30 | 17 |
| 2022.08.29. 21:45 | 17 |
| 2022.08.29. 22:00 | 17 |
| 2022.08.29. 22:15 | 17 |
| 2022.08.29. 22:30 | 17 |
| 2022.08.29. 22:45 | 17 |
| 2022.08.29. 23:00 | 17 |
| 2022.08.29. 23:15 | 17 |
| 2022.08.29. 23:30 | 17 |
| 2022.08.29. 23:45 | 17 |
| 2022.08.30. 00:00 | 17 |
| 2022.08.30. 00:15 | 17 |
| 2022.08.30. 00:30 | 17 |
| 2022.08.30. 00:45 | 17 |
| 2022.08.30. 01:00 | 17 |
| 2022.08.30. 01:15 | 17 |
| 2022.08.30. 01:30 | 17 |
| 2022.08.30. 01:45 | 17 |
| 2022.08.30. 02:00 | 17 |
| 2022.08.30. 02:15 | 17 |
| 2022.08.30. 02:30 | 17 |
| 2022.08.30. 02:45 | 17 |
| 2022.08.30. 03:00 | 17 |
| 2022.08.30. 03:15 | 17 |
| 2022.08.30. 03:30 | 17 |
| 2022.08.30. 03:45 | 17 |
| 2022.08.30. 04:00 | 17 |
| 2022.08.30. 04:15 | 17 |
| 2022.08.30. 04:30 | 17 |
| 2022.08.30. 04:45 | 17 |
| 2022.08.30. 05:00 | 17 |
| 2022.08.30. 05:15 | 17 |
| 2022.08.30. 05:30 | 17 |
| 2022.08.30. 05:45 | 17 |
| 2022.08.30. 06:00 | 17 |
| 2022.08.30. 06:15 | 17 |
| 2022.08.30. 06:30 | 17 |
| 2022.08.30. 06:45 | 17 |
| 2022.08.30. 07:00 | 17 |
| 2022.08.30. 07:15 | 17 |
| 2022.08.30. 07:30 | 17 |
| 2022.08.30. 07:45 | 17 |
| 2022.08.30. 08:00 | 17 |
| 2022.08.30. 08:15 | 17 |
| 2022.08.30. 08:30 | 17 |
| 2022.08.30. 08:45 | 17 |
| 2022.08.30. 09:00 | 17 |
| 2022.08.30. 09:15 | 17 |
| 2022.08.30. 09:30 | 17 |
| 2022.08.30. 09:45 | 17 |
| 2022.08.30. 10:00 | 17 |
| 2022.08.30. 10:15 | 17 |
| 2022.08.30. 10:30 | 17 |
| 2022.08.30. 10:45 | 17 |
| 2022.08.30. 11:00 | 17 |
| 2022.08.30. 11:15 | 17 |
| 2022.08.30. 11:30 | 17 |
| 2022.08.30. 11:45 | 17 |
| 2022.08.30. 12:00 | 17 |
| 2022.08.30. 12:15 | 17 |
| 2022.08.30. 12:30 | 17 |
| 2022.08.30. 12:45 | 17 |
| 2022.08.30. 13:00 | 17 |
| 2022.08.30. 13:15 | 17 |
| 2022.08.30. 13:30 | 17 |
| 2022.08.30. 13:45 | 17 |
| 2022.08.30. 14:00 | 17 |
| 2022.08.30. 14:15 | 17 |
| 2022.08.30. 14:30 | 17 |
| 2022.08.30. 14:45 | 17 |
| 2022.08.30. 15:00 | 17 |
| 2022.08.30. 15:15 | 17 |
| 2022.08.30. 15:30 | 17 |
| 2022.08.30. 15:45 | 17 |
| 2022.08.30. 16:00 | 17 |
| 2022.08.30. 16:15 | 17 |
| 2022.08.30. 16:30 | 17 |
| 2022.08.30. 16:45 | 17 |
| 2022.08.30. 17:00 | 17 |
| 2022.08.30. 17:15 | 17 |
| 2022.08.30. 17:30 | 17 |
| 2022.08.30. 17:45 | 17 |
| 2022.08.30. 18:00 | 17 |
| 2022.08.30. 18:15 | 17 |
| 2022.08.30. 18:30 | 17 |
| 2022.08.30. 18:45 | 17 |
| 2022.08.30. 19:00 | 17 |
| 2022.08.30. 19:15 | 17 |
| 2022.08.30. 19:30 | 17 |
| 2022.08.30. 19:45 | 17 |
| 2022.08.30. 20:00 | 17 |
| 2022.08.30. 20:15 | 17 |
| 2022.08.30. 20:30 | 17 |
| 2022.08.30. 20:45 | 17 |
| 2022.08.30. 21:00 | 17 |
| 2022.08.30. 21:15 | 17 |
| 2022.08.30. 21:30 | 17 |
| 2022.08.30. 21:45 | 17 |
| 2022.08.30. 22:00 | 17 |
| 2022.08.30. 22:15 | 17 |
| 2022.08.30. 22:30 | 17 |
| 2022.08.30. 22:45 | 17 |
| 2022.08.30. 23:00 | 17 |
| 2022.08.30. 23:15 | 17 |
| 2022.08.30. 23:30 | 17 |
| 2022.08.30. 23:45 | 17 |
| 2022.08.31. 00:00 | 17 |
| 2022.08.31. 00:15 | 17 |
| 2022.08.31. 00:30 | 17 |
| 2022.08.31. 00:45 | 17 |
| 2022.08.31. 01:00 | 17 |
| 2022.08.31. 01:15 | 17 |
| 2022.08.31. 01:30 | 17 |
| 2022.08.31. 01:45 | 17 |
| 2022.08.31. 02:00 | 17 |
| 2022.08.31. 02:15 | 17 |
| 2022.08.31. 02:30 | 17 |
| 2022.08.31. 02:45 | 17 |
| 2022.08.31. 03:00 | 17 |
| 2022.08.31. 03:15 | 17 |
| 2022.08.31. 03:30 | 17 |
| 2022.08.31. 03:45 | 17 |
| 2022.08.31. 04:00 | 17 |
| 2022.08.31. 04:15 | 17 |
| 2022.08.31. 04:30 | 17 |
| 2022.08.31. 04:45 | 17 |
| 2022.08.31. 05:00 | 17 |
| 2022.08.31. 05:15 | 17 |
| 2022.08.31. 05:30 | 17 |
| 2022.08.31. 05:45 | 17 |
| 2022.08.31. 06:00 | 17 |
| 2022.08.31. 06:15 | 17 |
| 2022.08.31. 06:30 | 17 |
| 2022.08.31. 06:45 | 17 |
| 2022.08.31. 07:00 | 17 |
| 2022.08.31. 07:15 | 17 |
| 2022.08.31. 07:30 | 17 |
| 2022.08.31. 07:45 | 17 |
| 2022.08.31. 08:00 | 17 |
| 2022.08.31. 08:15 | 17 |
| 2022.08.31. 08:30 | 17 |
| 2022.08.31. 08:45 | 17 |
| 2022.08.31. 09:00 | 17 |
| 2022.08.31. 09:15 | 17 |
| 2022.08.31. 09:30 | 17 |
| 2022.08.31. 09:45 | 17 |
| 2022.08.31. 10:00 | 17 |
| 2022.08.31. 10:15 | 17 |
| 2022.08.31. 10:30 | 17 |
| 2022.08.31. 10:45 | 17 |
| 2022.08.31. 11:00 | 17 |
| 2022.08.31. 11:15 | 17 |
| 2022.08.31. 11:30 | 17 |
| 2022.08.31. 11:45 | 17 |
| 2022.08.31. 12:00 | 17 |
| 2022.08.31. 12:15 | 17 |
| 2022.08.31. 12:30 | 17 |
| 2022.08.31. 12:45 | 17 |
| 2022.08.31. 13:00 | 17 |
| 2022.08.31. 13:15 | 17 |
| 2022.08.31. 13:30 | 17 |
| 2022.08.31. 13:45 | 17 |
| 2022.08.31. 14:00 | 17 |
| 2022.08.31. 14:15 | 17 |
| 2022.08.31. 14:30 | 17 |
| 2022.08.31. 14:45 | 17 |
| 2022.08.31. 15:00 | 17 |
| 2022.08.31. 15:15 | 17 |
| 2022.08.31. 15:30 | 17 |
| 2022.08.31. 15:45 | 17 |
| 2022.08.31. 16:00 | 17 |
| 2022.08.31. 16:15 | 17 |
| 2022.08.31. 16:30 | 17 |
| 2022.08.31. 16:45 | 17 |
| 2022.08.31. 17:00 | 17 |
| 2022.08.31. 17:15 | 17 |
| 2022.08.31. 17:30 | 17 |
| 2022.08.31. 17:45 | 17 |
| 2022.08.31. 18:00 | 17 |
| 2022.08.31. 18:15 | 17 |
| 2022.08.31. 18:30 | 17 |
| 2022.08.31. 18:45 | 17 |
| 2022.08.31. 19:00 | 17 |
| 2022.08.31. 19:15 | 17 |
| 2022.08.31. 19:30 | 17 |
| 2022.08.31. 19:45 | 17 |
| 2022.08.31. 20:00 | 17 |
| 2022.08.31. 20:15 | 17 |
| 2022.08.31. 20:30 | 17 |
| 2022.08.31. 20:45 | 17 |
| 2022.08.31. 21:00 | 17 |
| 2022.08.31. 21:15 | 17 |
| 2022.08.31. 21:30 | 17 |
| 2022.08.31. 21:45 | 17 |
| 2022.08.31. 22:00 | 17 |
| 2022.08.31. 22:15 | 17 |
| 2022.08.31. 22:30 | 17 |
| 2022.08.31. 22:45 | 17 |
| 2022.08.31. 23:00 | 17 |
| 2022.08.31. 23:15 | 17 |
| 2022.08.31. 23:30 | 17 |
| 2022.08.31. 23:45 | 17 |
| 2022.09.01. 00:00 | 17 |
| 2022.09.01. 00:15 | 17 |
| 2022.09.01. 00:30 | 17 |
| 2022.09.01. 00:45 | 17 |
| 2022.09.01. 01:00 | 17 |
| 2022.09.01. 01:15 | 17 |
| 2022.09.01. 01:30 | 17 |
| 2022.09.01. 01:45 | 17 |
| 2022.09.01. 02:00 | 17 |
| 2022.09.01. 02:15 | 17 |
| 2022.09.01. 02:30 | 17 |
| 2022.09.01. 02:45 | 17 |
| 2022.09.01. 03:00 | 17 |
| 2022.09.01. 03:15 | 17 |
| 2022.09.01. 03:30 | 17 |
| 2022.09.01. 03:45 | 17 |
| 2022.09.01. 04:00 | 17 |
| 2022.09.01. 04:15 | 17 |
| 2022.09.01. 04:30 | 17 |
| 2022.09.01. 04:45 | 17 |
| 2022.09.01. 05:00 | 17 |
| 2022.09.01. 05:15 | 17 |
| 2022.09.01. 05:30 | 17 |
| 2022.09.01. 05:45 | 17 |
| 2022.09.01. 06:00 | 17 |
| 2022.09.01. 06:15 | 17 |
| 2022.09.01. 06:30 | 17 |
| 2022.09.01. 06:45 | 17 |
| 2022.09.01. 07:00 | 17 |
| 2022.09.01. 07:15 | 17 |
| 2022.09.01. 07:30 | 17 |
| 2022.09.01. 07:45 | 17 |
| 2022.09.01. 08:00 | 17 |
| 2022.09.01. 08:15 | 17 |
| 2022.09.01. 08:30 | 17 |
| 2022.09.01. 08:45 | 17 |
| 2022.09.01. 09:00 | 17 |
| 2022.09.01. 09:15 | 17 |
| 2022.09.01. 09:30 | 17 |
| 2022.09.01. 09:45 | 17 |
| 2022.09.01. 10:00 | 17 |
| 2022.09.01. 10:15 | 17 |
| 2022.09.01. 10:30 | 17 |
| 2022.09.01. 10:45 | 17 |
| 2022.09.01. 11:00 | 17 |
| 2022.09.01. 11:15 | 17 |
| 2022.09.01. 11:30 | 17 |
| 2022.09.01. 11:45 | 17 |
| 2022.09.01. 12:00 | 17 |
| 2022.09.01. 12:15 | 17 |
| 2022.09.01. 12:30 | 17 |
| 2022.09.01. 12:45 | 17 |
| 2022.09.01. 13:00 | 17 |
| 2022.09.01. 13:15 | 17 |
| 2022.09.01. 13:30 | 17 |
| 2022.09.01. 13:45 | 17 |
| 2022.09.01. 14:00 | 17 |
| 2022.09.01. 14:15 | 17 |
| 2022.09.01. 14:30 | 17 |
| 2022.09.01. 14:45 | 17 |
| 2022.09.01. 15:00 | 17 |
| 2022.09.01. 15:15 | 17 |
| 2022.09.01. 15:30 | 17 |
| 2022.09.01. 15:45 | 17 |
| 2022.09.01. 16:00 | 17 |
| 2022.09.01. 16:15 | 17 |
| 2022.09.01. 16:30 | 17 |
| 2022.09.01. 16:45 | 17 |
| 2022.09.01. 17:00 | 17 |
| 2022.09.01. 17:15 | 17 |
| 2022.09.01. 17:30 | 17 |
| 2022.09.01. 17:45 | 17 |
| 2022.09.01. 18:00 | 17 |
| 2022.09.01. 18:15 | 17 |
| 2022.09.01. 18:30 | 17 |
| 2022.09.01. 18:45 | 17 |
| 2022.09.01. 19:00 | 17 |
| 2022.09.01. 19:15 | 17 |
| 2022.09.01. 19:30 | 17 |
| 2022.09.01. 19:45 | 17 |
| 2022.09.01. 20:00 | 17 |
| 2022.09.01. 20:15 | 17 |
| 2022.09.01. 20:30 | 17 |
| 2022.09.01. 20:45 | 17 |
| 2022.09.01. 21:00 | 17 |
| 2022.09.01. 21:15 | 17 |
| 2022.09.01. 21:30 | 17 |
| 2022.09.01. 21:45 | 17 |
| 2022.09.01. 22:00 | 17 |
| 2022.09.01. 22:15 | 17 |
| 2022.09.01. 22:30 | 17 |
| 2022.09.01. 22:45 | 17 |
| 2022.09.01. 23:00 | 17 |
| 2022.09.01. 23:15 | 17 |
| 2022.09.01. 23:30 | 17 |
| 2022.09.01. 23:45 | 17 |
| 2022.09.02. 00:00 | 17 |
| 2022.09.02. 00:15 | 17 |
| 2022.09.02. 00:30 | 17 |
| 2022.09.02. 00:45 | 17 |
| 2022.09.02. 01:00 | 17 |
| 2022.09.02. 01:15 | 17 |
| 2022.09.02. 01:30 | 17 |
| 2022.09.02. 01:45 | 17 |
| 2022.09.02. 02:00 | 17 |
| 2022.09.02. 02:15 | 17 |
| 2022.09.02. 02:30 | 17 |
| 2022.09.02. 02:45 | 17 |
| 2022.09.02. 03:00 | 17 |
| 2022.09.02. 03:15 | 17 |
| 2022.09.02. 03:30 | 17 |
| 2022.09.02. 03:45 | 17 |
| 2022.09.02. 04:00 | 17 |
| 2022.09.02. 04:15 | 17 |
| 2022.09.02. 04:30 | 17 |
| 2022.09.02. 04:45 | 17 |
| 2022.09.02. 05:00 | 17 |
| 2022.09.02. 05:15 | 17 |
| 2022.09.02. 05:30 | 17 |
| 2022.09.02. 05:45 | 17 |
| 2022.09.02. 06:00 | 17 |
| 2022.09.02. 06:15 | 17 |
| 2022.09.02. 06:30 | 17 |
| 2022.09.02. 06:45 | 17 |
| 2022.09.02. 07:00 | 17 |
| 2022.09.02. 07:15 | 17 |
| 2022.09.02. 07:30 | 17 |
| 2022.09.02. 07:45 | 17 |
| 2022.09.02. 08:00 | 17 |
| 2022.09.02. 08:15 | 17 |
| 2022.09.02. 08:30 | 17 |
| 2022.09.02. 08:45 | 17 |
| 2022.09.02. 09:00 | 17 |
| 2022.09.02. 09:15 | 17 |
| 2022.09.02. 09:30 | 17 |
| 2022.09.02. 09:45 | 17 |
| 2022.09.02. 10:00 | 17 |
| 2022.09.02. 10:15 | 17 |
| 2022.09.02. 10:30 | 17 |
| 2022.09.02. 10:45 | 17 |
| 2022.09.02. 11:00 | 17 |
| 2022.09.02. 11:15 | 17 |
| 2022.09.02. 11:30 | 17 |
| 2022.09.02. 11:45 | 17 |
| 2022.09.02. 12:00 | 17 |
| 2022.09.02. 12:15 | 17 |
| 2022.09.02. 12:30 | 17 |
| 2022.09.02. 12:45 | 17 |
| 2022.09.02. 13:00 | 17 |
| 2022.09.02. 13:15 | 17 |
| 2022.09.02. 13:30 | 17 |
| 2022.09.02. 13:45 | 17 |
| 2022.09.02. 14:00 | 17 |
| 2022.09.02. 14:15 | 17 |
| 2022.09.02. 14:30 | 17 |
| 2022.09.02. 14:45 | 17 |
| 2022.09.02. 15:00 | 17 |
| 2022.09.02. 15:15 | 17 |
| 2022.09.02. 15:30 | 17 |
| 2022.09.02. 15:45 | 17 |
| 2022.09.02. 16:00 | 17 |
| 2022.09.02. 16:15 | 17 |
| 2022.09.02. 16:30 | 17 |
| 2022.09.02. 16:45 | 17 |
| 2022.09.02. 17:00 | 17 |
| 2022.09.02. 17:15 | 17 |
| 2022.09.02. 17:30 | 17 |
| 2022.09.02. 17:45 | 17 |
| 2022.09.02. 18:00 | 17 |
| 2022.09.02. 18:15 | 17 |
| 2022.09.02. 18:30 | 17 |
| 2022.09.02. 18:45 | 17 |
| 2022.09.02. 19:00 | 17 |
| 2022.09.02. 19:15 | 17 |
| 2022.09.02. 19:30 | 17 |
| 2022.09.02. 19:45 | 17 |
| 2022.09.02. 20:00 | 17 |
| 2022.09.02. 20:15 | 17 |
| 2022.09.02. 20:30 | 17 |
| 2022.09.02. 20:45 | 17 |
| 2022.09.02. 21:00 | 17 |
| 2022.09.02. 21:15 | 17 |
| 2022.09.02. 21:30 | 17 |
| 2022.09.02. 21:45 | 17 |
| 2022.09.02. 22:00 | 17 |
| 2022.09.02. 22:15 | 17 |
| 2022.09.02. 22:30 | 17 |
| 2022.09.02. 22:45 | 17 |
| 2022.09.02. 23:00 | 17 |
| 2022.09.02. 23:15 | 17 |
| 2022.09.02. 23:30 | 17 |
| 2022.09.02. 23:45 | 17 |
| 2022.09.03. 00:00 | 17 |
| 2022.09.03. 00:15 | 17 |
| 2022.09.03. 00:30 | 17 |
| 2022.09.03. 00:45 | 17 |
| 2022.09.03. 01:00 | 17 |
| 2022.09.03. 01:15 | 17 |
| 2022.09.03. 01:30 | 17 |
| 2022.09.03. 01:45 | 17 |
| 2022.09.03. 02:00 | 17 |
| 2022.09.03. 02:15 | 17 |
| 2022.09.03. 02:30 | 17 |
| 2022.09.03. 02:45 | 17 |
| 2022.09.03. 03:00 | 17 |
| 2022.09.03. 03:15 | 17 |
| 2022.09.03. 03:30 | 17 |
| 2022.09.03. 03:45 | 17 |
| 2022.09.03. 04:00 | 17 |
| 2022.09.03. 04:15 | 17 |
| 2022.09.03. 04:30 | 17 |
| 2022.09.03. 04:45 | 17 |
| 2022.09.03. 05:00 | 17 |
| 2022.09.03. 05:15 | 17 |
| 2022.09.03. 05:30 | 17 |
| 2022.09.03. 05:45 | 17 |
| 2022.09.03. 06:00 | 17 |
| 2022.09.03. 06:15 | 17 |
| 2022.09.03. 06:30 | 17 |
| 2022.09.03. 06:45 | 17 |
| 2022.09.03. 07:00 | 17 |
| 2022.09.03. 07:15 | 17 |
| 2022.09.03. 07:30 | 17 |
| 2022.09.03. 07:45 | 17 |
| 2022.09.03. 08:00 | 17 |
| 2022.09.03. 08:15 | 17 |
| 2022.09.03. 08:30 | 17 |
| 2022.09.03. 08:45 | 17 |
| 2022.09.03. 09:00 | 17 |
| 2022.09.03. 09:15 | 17 |
| 2022.09.03. 09:30 | 17 |
| 2022.09.03. 09:45 | 17 |
| 2022.09.03. 10:00 | 17 |
| 2022.09.03. 10:15 | 17 |
| 2022.09.03. 10:30 | 17 |
| 2022.09.03. 10:45 | 17 |
| 2022.09.03. 11:00 | 17 |
| 2022.09.03. 11:15 | 17 |
| 2022.09.03. 11:30 | 17 |
| 2022.09.03. 11:45 | 17 |
| 2022.09.03. 12:00 | 17 |
| 2022.09.03. 12:15 | 17 |
| 2022.09.03. 12:30 | 17 |
| 2022.09.03. 12:45 | 17 |
| 2022.09.03. 13:00 | 17 |
| 2022.09.03. 13:15 | 17 |
| 2022.09.03. 13:30 | 17 |
| 2022.09.03. 13:45 | 17 |
| 2022.09.03. 14:00 | 17 |
| 2022.09.03. 14:15 | 17 |
| 2022.09.03. 14:30 | 17 |
| 2022.09.03. 14:45 | 17 |
| 2022.09.03. 15:00 | 17 |
| 2022.09.03. 15:15 | 17 |
| 2022.09.03. 15:30 | 17 |
| 2022.09.03. 15:45 | 17 |
| 2022.09.03. 16:00 | 17 |
| 2022.09.03. 16:15 | 17 |
| 2022.09.03. 16:30 | 17 |
| 2022.09.03. 16:45 | 17 |
| 2022.09.03. 17:00 | 17 |
| 2022.09.03. 17:15 | 17 |
| 2022.09.03. 17:30 | 17 |
| 2022.09.03. 17:45 | 17 |
| 2022.09.03. 18:00 | 17 |
| 2022.09.03. 18:15 | 17 |
| 2022.09.03. 18:30 | 17 |
| 2022.09.03. 18:45 | 17 |
| 2022.09.03. 19:00 | 17 |
| 2022.09.03. 19:15 | 17 |
| 2022.09.03. 19:30 | 17 |
| 2022.09.03. 19:45 | 17 |
| 2022.09.03. 20:00 | 17 |
| 2022.09.03. 20:15 | 17 |
| 2022.09.03. 20:30 | 17 |
| 2022.09.03. 20:45 | 17 |
| 2022.09.03. 21:00 | 17 |
| 2022.09.03. 21:15 | 17 |
| 2022.09.03. 21:30 | 17 |
| 2022.09.03. 21:45 | 17 |
| 2022.09.03. 22:00 | 17 |
| 2022.09.03. 22:15 | 17 |
| 2022.09.03. 22:30 | 17 |
| 2022.09.03. 22:45 | 17 |
| 2022.09.03. 23:00 | 17 |
| 2022.09.03. 23:15 | 17 |
| 2022.09.03. 23:30 | 17 |
| 2022.09.03. 23:45 | 17 |
| 2022.09.04. 00:00 | 17 |
| 2022.09.04. 00:15 | 17 |
| 2022.09.04. 00:30 | 17 |
| 2022.09.04. 00:45 | 17 |
| 2022.09.04. 01:00 | 17 |
| 2022.09.04. 01:15 | 17 |
| 2022.09.04. 01:30 | 17 |
| 2022.09.04. 01:45 | 17 |
| 2022.09.04. 02:00 | 17 |
| 2022.09.04. 02:15 | 17 |
| 2022.09.04. 02:30 | 17 |
| 2022.09.04. 02:45 | 17 |
| 2022.09.04. 03:00 | 17 |
| 2022.09.04. 03:15 | 17 |
| 2022.09.04. 03:30 | 17 |
| 2022.09.04. 03:45 | 17 |
| 2022.09.04. 04:00 | 17 |
| 2022.09.04. 04:15 | 17 |
| 2022.09.04. 04:30 | 17 |
| 2022.09.04. 04:45 | 17 |
| 2022.09.04. 05:00 | 17 |
| 2022.09.04. 05:15 | 17 |
| 2022.09.04. 05:30 | 17 |
| 2022.09.04. 05:45 | 17 |
| 2022.09.04. 06:00 | 17 |
| 2022.09.04. 06:15 | 17 |
| 2022.09.04. 06:30 | 17 |
| 2022.09.04. 06:45 | 17 |
| 2022.09.04. 07:00 | 17 |
| 2022.09.04. 07:15 | 17 |
| 2022.09.04. 07:30 | 17 |
| 2022.09.04. 07:45 | 17 |
| 2022.09.04. 08:00 | 17 |
| 2022.09.04. 08:15 | 17 |
| 2022.09.04. 08:30 | 17 |
| 2022.09.04. 08:45 | 17 |
| 2022.09.04. 09:00 | 17 |
| 2022.09.04. 09:15 | 17 |
| 2022.09.04. 09:30 | 17 |
| 2022.09.04. 09:45 | 17 |
| 2022.09.04. 10:00 | 17 |
| 2022.09.04. 10:15 | 17 |
| 2022.09.04. 10:30 | 17 |
| 2022.09.04. 10:45 | 17 |
| 2022.09.04. 11:00 | 17 |
| 2022.09.04. 11:15 | 17 |
| 2022.09.04. 11:30 | 17 |
| 2022.09.04. 11:45 | 17 |
| 2022.09.04. 12:00 | 17 |
| 2022.09.04. 12:15 | 17 |
| 2022.09.04. 12:30 | 17 |
| 2022.09.04. 12:45 | 17 |
| 2022.09.04. 13:00 | 17 |
| 2022.09.04. 13:15 | 17 |
| 2022.09.04. 13:30 | 17 |
| 2022.09.04. 13:45 | 17 |
| 2022.09.04. 14:00 | 17 |
| 2022.09.04. 14:15 | 17 |
| 2022.09.04. 14:30 | 17 |
| 2022.09.04. 14:45 | 17 |
| 2022.09.04. 15:00 | 17 |
| 2022.09.04. 15:15 | 17 |
| 2022.09.04. 15:30 | 17 |
| 2022.09.04. 15:45 | 17 |
| 2022.09.04. 16:00 | 17 |
| 2022.09.04. 16:15 | 17 |
| 2022.09.04. 16:30 | 17 |
| 2022.09.04. 16:45 | 17 |
| 2022.09.04. 17:00 | 17 |
| 2022.09.04. 17:15 | 17 |
| 2022.09.04. 17:30 | 17 |
| 2022.09.04. 17:45 | 17 |
| 2022.09.04. 18:00 | 17 |
| 2022.09.04. 18:15 | 17 |
| 2022.09.04. 18:30 | 17 |
| 2022.09.04. 18:45 | 17 |
| 2022.09.04. 19:00 | 17 |
| 2022.09.04. 19:15 | 17 |
| 2022.09.04. 19:30 | 17 |
| 2022.09.04. 19:45 | 17 |
| 2022.09.04. 20:00 | 17 |
| 2022.09.04. 20:15 | 17 |
| 2022.09.04. 20:30 | 17 |
| 2022.09.04. 20:45 | 17 |
| 2022.09.04. 21:00 | 17 |
| 2022.09.04. 21:15 | 17 |
| 2022.09.04. 21:30 | 17 |
| 2022.09.04. 21:45 | 17 |
| 2022.09.04. 22:00 | 17 |
| 2022.09.04. 22:15 | 17 |
| 2022.09.04. 22:30 | 17 |
| 2022.09.04. 22:45 | 17 |
| 2022.09.04. 23:00 | 17 |
| 2022.09.04. 23:15 | 17 |
| 2022.09.04. 23:30 | 17 |
| 2022.09.04. 23:45 | 17 |
| 2022.09.05. 00:00 | 17 |
| 2022.09.05. 00:15 | 17 |
| 2022.09.05. 00:30 | 17 |
| 2022.09.05. 00:45 | 17 |
| 2022.09.05. 01:00 | 17 |
| 2022.09.05. 01:15 | 17 |
| 2022.09.05. 01:30 | 17 |
| 2022.09.05. 01:45 | 17 |
| 2022.09.05. 02:00 | 17 |
| 2022.09.05. 02:15 | 17 |
| 2022.09.05. 02:30 | 17 |
| 2022.09.05. 02:45 | 17 |
| 2022.09.05. 03:00 | 17 |
| 2022.09.05. 03:15 | 17 |
| 2022.09.05. 03:30 | 17 |
| 2022.09.05. 03:45 | 17 |
| 2022.09.05. 04:00 | 17 |
| 2022.09.05. 04:15 | 17 |
| 2022.09.05. 04:30 | 17 |
| 2022.09.05. 04:45 | 17 |
| 2022.09.05. 05:00 | 17 |
| 2022.09.05. 05:15 | 17 |
| 2022.09.05. 05:30 | 17 |
| 2022.09.05. 05:45 | 17 |
| 2022.09.05. 06:00 | 17 |
| 2022.09.05. 06:15 | 17 |
| 2022.09.05. 06:30 | 17 |
| 2022.09.05. 06:45 | 17 |
| 2022.09.05. 07:00 | 17 |
| 2022.09.05. 07:15 | 17 |
| 2022.09.05. 07:30 | 17 |
| 2022.09.05. 07:45 | 17 |
| 2022.09.05. 08:00 | 17 |
| 2022.09.05. 08:15 | 17 |
| 2022.09.05. 08:30 | 17 |
| 2022.09.05. 08:45 | 17 |
| 2022.09.05. 09:00 | 17 |
| 2022.09.05. 09:15 | 17 |
| 2022.09.05. 09:30 | 17 |
| 2022.09.05. 09:45 | 17 |
| 2022.09.05. 10:00 | 17 |
| 2022.09.05. 10:15 | 17 |
| 2022.09.05. 10:30 | 17 |
| 2022.09.05. 10:45 | 17 |
| 2022.09.05. 11:00 | 17 |
| 2022.09.05. 11:15 | 17 |
| 2022.09.05. 11:30 | 17 |
| 2022.09.05. 11:45 | 17 |
| 2022.09.05. 12:00 | 17 |
| 2022.09.05. 12:15 | 17 |
| 2022.09.05. 12:30 | 17 |
| 2022.09.05. 12:45 | 17 |
| 2022.09.05. 13:00 | 17 |
| 2022.09.05. 13:15 | 17 |
| 2022.09.05. 13:30 | 17 |
| 2022.09.05. 13:45 | 17 |
| 2022.09.05. 14:00 | 17 |
| 2022.09.05. 14:15 | 17 |
| 2022.09.05. 14:30 | 17 |
| 2022.09.05. 14:45 | 17 |
| 2022.09.05. 15:00 | 17 |
| 2022.09.05. 15:15 | 17 |
| 2022.09.05. 15:30 | 17 |
| 2022.09.05. 15:45 | 17 |
| 2022.09.05. 16:00 | 17 |
| 2022.09.05. 16:15 | 17 |
| 2022.09.05. 16:30 | 17 |
| 2022.09.05. 16:45 | 17 |
| 2022.09.05. 17:00 | 17 |
| 2022.09.05. 17:15 | 17 |
| 2022.09.05. 17:30 | 17 |
| 2022.09.05. 17:45 | 17 |
| 2022.09.05. 18:00 | 17 |
| 2022.09.05. 18:15 | 17 |
| 2022.09.05. 18:30 | 17 |
| 2022.09.05. 18:45 | 17 |
| 2022.09.05. 19:00 | 17 |
| 2022.09.05. 19:15 | 17 |
| 2022.09.05. 19:30 | 17 |
| 2022.09.05. 19:45 | 17 |
| 2022.09.05. 20:00 | 17 |
| 2022.09.05. 20:15 | 17 |
| 2022.09.05. 20:30 | 17 |
| 2022.09.05. 20:45 | 17 |
| 2022.09.05. 21:00 | 17 |
| 2022.09.05. 21:15 | 17 |
| 2022.09.05. 21:30 | 17 |
| 2022.09.05. 21:45 | 17 |
| 2022.09.05. 22:00 | 17 |
| 2022.09.05. 22:15 | 17 |
| 2022.09.05. 22:30 | 17 |
| 2022.09.05. 22:45 | 17 |
| 2022.09.05. 23:00 | 17 |
| 2022.09.05. 23:15 | 17 |
| 2022.09.05. 23:30 | 17 |
| 2022.09.05. 23:45 | 17 |
| 2022.09.06. 00:00 | 17 |
| 2022.09.06. 00:15 | 17 |
| 2022.09.06. 00:30 | 17 |
| 2022.09.06. 00:45 | 17 |
| 2022.09.06. 01:00 | 17 |
| 2022.09.06. 01:15 | 17 |
| 2022.09.06. 01:30 | 17 |
| 2022.09.06. 01:45 | 17 |
| 2022.09.06. 02:00 | 17 |
| 2022.09.06. 02:15 | 17 |
| 2022.09.06. 02:30 | 17 |
| 2022.09.06. 02:45 | 17 |
| 2022.09.06. 03:00 | 17 |
| 2022.09.06. 03:15 | 17 |
| 2022.09.06. 03:30 | 17 |
| 2022.09.06. 03:45 | 17 |
| 2022.09.06. 04:00 | 17 |
| 2022.09.06. 04:15 | 17 |
| 2022.09.06. 04:30 | 17 |
| 2022.09.06. 04:45 | 17 |
| 2022.09.06. 05:00 | 17 |
| 2022.09.06. 05:15 | 17 |
| 2022.09.06. 05:30 | 17 |
| 2022.09.06. 05:45 | 17 |
| 2022.09.06. 06:00 | 17 |
| 2022.09.06. 06:15 | 17 |
| 2022.09.06. 06:30 | 17 |
| 2022.09.06. 06:45 | 17 |
| 2022.09.06. 07:00 | 17 |
| 2022.09.06. 07:15 | 17 |
| 2022.09.06. 07:30 | 17 |
| 2022.09.06. 07:45 | 17 |
| 2022.09.06. 08:00 | 17 |
| 2022.09.06. 08:15 | 17 |
| 2022.09.06. 08:30 | 17 |
| 2022.09.06. 08:45 | 17 |
| 2022.09.06. 09:00 | 17 |
| 2022.09.06. 09:15 | 17 |
| 2022.09.06. 09:30 | 17 |
| 2022.09.06. 09:45 | 17 |
| 2022.09.06. 10:00 | 17 |
| 2022.09.06. 10:15 | 17 |
| 2022.09.06. 10:30 | 17 |
| 2022.09.06. 10:45 | 17 |
| 2022.09.06. 11:00 | 17 |
| 2022.09.06. 11:15 | 17 |
| 2022.09.06. 11:30 | 17 |
| 2022.09.06. 11:45 | 17 |
| 2022.09.06. 12:00 | 17 |
| 2022.09.06. 12:15 | 17 |
| 2022.09.06. 12:30 | 17 |
| 2022.09.06. 12:45 | 17 |
| 2022.09.06. 13:00 | 17 |
| 2022.09.06. 13:15 | 17 |
| 2022.09.06. 13:30 | 17 |
| 2022.09.06. 13:45 | 17 |
| 2022.09.06. 14:00 | 17 |
| 2022.09.06. 14:15 | 17 |
| 2022.09.06. 14:30 | 17 |
| 2022.09.06. 14:45 | 17 |
| 2022.09.06. 15:00 | 17 |
| 2022.09.06. 15:15 | 17 |
| 2022.09.06. 15:30 | 17 |
| 2022.09.06. 15:45 | 17 |
| 2022.09.06. 16:00 | 17 |
| 2022.09.06. 16:15 | 17 |
| 2022.09.06. 16:30 | 17 |
| 2022.09.06. 16:45 | 17 |
| 2022.09.06. 17:00 | 17 |
| 2022.09.06. 17:15 | 17 |
| 2022.09.06. 17:30 | 17 |
| 2022.09.06. 17:45 | 17 |
| 2022.09.06. 18:00 | 17 |
| 2022.09.06. 18:15 | 17 |
| 2022.09.06. 18:30 | 17 |
| 2022.09.06. 18:45 | 17 |
| 2022.09.06. 19:00 | 17 |
| 2022.09.06. 19:15 | 17 |
| 2022.09.06. 19:30 | 17 |
| 2022.09.06. 19:45 | 17 |
| 2022.09.06. 20:00 | 17 |
| 2022.09.06. 20:15 | 17 |
| 2022.09.06. 20:30 | 17 |
| 2022.09.06. 20:45 | 17 |
| 2022.09.06. 21:00 | 17 |
| 2022.09.06. 21:15 | 17 |
| 2022.09.06. 21:30 | 17 |
| 2022.09.06. 21:45 | 17 |
| 2022.09.06. 22:00 | 17 |
| 2022.09.06. 22:15 | 17 |
| 2022.09.06. 22:30 | 17 |
| 2022.09.06. 22:45 | 17 |
| 2022.09.06. 23:00 | 17 |
| 2022.09.06. 23:15 | 17 |
| 2022.09.06. 23:30 | 17 |
| 2022.09.06. 23:45 | 17 |
| 2022.09.07. 00:00 | 17 |
| 2022.09.07. 00:15 | 17 |
| 2022.09.07. 00:30 | 17 |
| 2022.09.07. 00:45 | 17 |
| 2022.09.07. 01:00 | 17 |
| 2022.09.07. 01:15 | 17 |
| 2022.09.07. 01:30 | 17 |
| 2022.09.07. 01:45 | 17 |
| 2022.09.07. 02:00 | 17 |
| 2022.09.07. 02:15 | 17 |
| 2022.09.07. 02:30 | 17 |
| 2022.09.07. 02:45 | 17 |
| 2022.09.07. 03:00 | 17 |
| 2022.09.07. 03:15 | 17 |
| 2022.09.07. 03:30 | 17 |
| 2022.09.07. 03:45 | 17 |
| 2022.09.07. 04:00 | 17 |
| 2022.09.07. 04:15 | 17 |
| 2022.09.07. 04:30 | 17 |
| 2022.09.07. 04:45 | 17 |
| 2022.09.07. 05:00 | 17 |
| 2022.09.07. 05:15 | 17 |
| 2022.09.07. 05:30 | 17 |
| 2022.09.07. 05:45 | 17 |
| 2022.09.07. 06:00 | 17 |
| 2022.09.07. 06:15 | 17 |
| 2022.09.07. 06:30 | 17 |
| 2022.09.07. 06:45 | 17 |
| 2022.09.07. 07:00 | 17 |
| 2022.09.07. 07:15 | 17 |
| 2022.09.07. 07:30 | 17 |
| 2022.09.07. 07:45 | 17 |
| 2022.09.07. 08:00 | 17 |
| 2022.09.07. 08:15 | 17 |
| 2022.09.07. 08:30 | 17 |
| 2022.09.07. 08:45 | 17 |
| 2022.09.07. 09:00 | 17 |
| 2022.09.07. 09:15 | 17 |
| 2022.09.07. 09:30 | 17 |
| 2022.09.07. 09:45 | 17 |
| 2022.09.07. 10:00 | 17 |
| 2022.09.07. 10:15 | 17 |
| 2022.09.07. 10:30 | 17 |
| 2022.09.07. 10:45 | 17 |
| 2022.09.07. 11:00 | 17 |
| 2022.09.07. 11:15 | 17 |
| 2022.09.07. 11:30 | 17 |
| 2022.09.07. 11:45 | 17 |
| 2022.09.07. 12:00 | 17 |
| 2022.09.07. 12:15 | 17 |
| 2022.09.07. 12:30 | 17 |
| 2022.09.07. 12:45 | 17 |
| 2022.09.07. 13:00 | 17 |
| 2022.09.07. 13:15 | 17 |
| 2022.09.07. 13:30 | 17 |
| 2022.09.07. 13:45 | 17 |
| 2022.09.07. 14:00 | 17 |
| 2022.09.07. 14:15 | 17 |
| 2022.09.07. 14:30 | 17 |
| 2022.09.07. 14:45 | 17 |
| 2022.09.07. 15:00 | 17 |
| 2022.09.07. 15:15 | 17 |
| 2022.09.07. 15:30 | 17 |
| 2022.09.07. 15:45 | 17 |
| 2022.09.07. 16:00 | 17 |
| 2022.09.07. 16:15 | 17 |
| 2022.09.07. 16:30 | 17 |
| 2022.09.07. 16:45 | 17 |
| 2022.09.07. 17:00 | 17 |
| 2022.09.07. 17:15 | 17 |
| 2022.09.07. 17:30 | 17 |
| 2022.09.07. 17:45 | 17 |
| 2022.09.07. 18:00 | 17 |
| 2022.09.07. 18:15 | 17 |
| 2022.09.07. 18:30 | 17 |
| 2022.09.07. 18:45 | 17 |
| 2022.09.07. 19:00 | 17 |
| 2022.09.07. 19:15 | 17 |
| 2022.09.07. 19:30 | 17 |
| 2022.09.07. 19:45 | 17 |
| 2022.09.07. 20:00 | 17 |
| 2022.09.07. 20:15 | 17 |
| 2022.09.07. 20:30 | 17 |
| 2022.09.07. 20:45 | 17 |
| 2022.09.07. 21:00 | 17 |
| 2022.09.07. 21:15 | 17 |
| 2022.09.07. 21:30 | 17 |
| 2022.09.07. 21:45 | 17 |
| 2022.09.07. 22:00 | 17 |
| 2022.09.07. 22:15 | 17 |
| 2022.09.07. 22:30 | 17 |
| 2022.09.07. 22:45 | 17 |
| 2022.09.07. 23:00 | 17 |
| 2022.09.07. 23:15 | 17 |
| 2022.09.07. 23:30 | 17 |
| 2022.09.07. 23:45 | 17 |
| 2022.09.08. 00:00 | 17 |
| 2022.09.08. 00:15 | 17 |
| 2022.09.08. 00:30 | 17 |
| 2022.09.08. 00:45 | 17 |
| 2022.09.08. 01:00 | 17 |
| 2022.09.08. 01:15 | 17 |
| 2022.09.08. 01:30 | 17 |
| 2022.09.08. 01:45 | 17 |
| 2022.09.08. 02:00 | 17 |
| 2022.09.08. 02:15 | 17 |
| 2022.09.08. 02:30 | 17 |
| 2022.09.08. 02:45 | 17 |
| 2022.09.08. 03:00 | 17 |
| 2022.09.08. 03:15 | 17 |
| 2022.09.08. 03:30 | 17 |
| 2022.09.08. 03:45 | 17 |
| 2022.09.08. 04:00 | 17 |
| 2022.09.08. 04:15 | 17 |
| 2022.09.08. 04:30 | 17 |
| 2022.09.08. 04:45 | 17 |
| 2022.09.08. 05:00 | 17 |
| 2022.09.08. 05:15 | 17 |
| 2022.09.08. 05:30 | 17 |
| 2022.09.08. 05:45 | 17 |
| 2022.09.08. 06:00 | 17 |
| 2022.09.08. 06:15 | 17 |
| 2022.09.08. 06:30 | 17 |
| 2022.09.08. 06:45 | 17 |
| 2022.09.08. 07:00 | 17 |
| 2022.09.08. 07:15 | 17 |
| 2022.09.08. 07:30 | 17 |
| 2022.09.08. 07:45 | 17 |
| 2022.09.08. 08:00 | 17 |
| 2022.09.08. 08:15 | 17 |
| 2022.09.08. 08:30 | 17 |
| 2022.09.08. 08:45 | 17 |
| 2022.09.08. 09:00 | 17 |
| 2022.09.08. 09:15 | 17 |
| 2022.09.08. 09:30 | 17 |
| 2022.09.08. 09:45 | 17 |
| 2022.09.08. 10:00 | 17 |
| 2022.09.08. 10:15 | 17 |
| 2022.09.08. 10:30 | 17 |
| 2022.09.08. 10:45 | 17 |
| 2022.09.08. 11:00 | 17 |
| 2022.09.08. 11:15 | 17 |
| 2022.09.08. 11:30 | 17 |
| 2022.09.08. 11:45 | 17 |
| 2022.09.08. 12:00 | 17 |
| 2022.09.08. 12:15 | 17 |
| 2022.09.08. 12:30 | 17 |
| 2022.09.08. 12:45 | 17 |
| 2022.09.08. 13:00 | 17 |
| 2022.09.08. 13:15 | 17 |
| 2022.09.08. 13:30 | 17 |
| 2022.09.08. 13:45 | 17 |
| 2022.09.08. 14:00 | 17 |
| 2022.09.08. 14:15 | 17 |
| 2022.09.08. 14:30 | 17 |
| 2022.09.08. 14:45 | 17 |
| 2022.09.08. 15:00 | 17 |
| 2022.09.08. 15:15 | 17 |
| 2022.09.08. 15:30 | 17 |
| 2022.09.08. 15:45 | 17 |
| 2022.09.08. 16:00 | 17 |
| 2022.09.08. 16:15 | 17 |
| 2022.09.08. 16:30 | 17 |
| 2022.09.08. 16:45 | 17 |
| 2022.09.08. 17:00 | 17 |
| 2022.09.08. 17:15 | 17 |
| 2022.09.08. 17:30 | 17 |
| 2022.09.08. 17:45 | 17 |
| 2022.09.08. 18:00 | 17 |
| 2022.09.08. 18:15 | 17 |
| 2022.09.08. 18:30 | 17 |
| 2022.09.08. 18:45 | 17 |
| 2022.09.08. 19:00 | 17 |
| 2022.09.08. 19:15 | 17 |
| 2022.09.08. 19:30 | 17 |
| 2022.09.08. 19:45 | 17 |
| 2022.09.08. 20:00 | 17 |
| 2022.09.08. 20:15 | 17 |
| 2022.09.08. 20:30 | 17 |
| 2022.09.08. 20:45 | 17 |
| 2022.09.08. 21:00 | 17 |
| 2022.09.08. 21:15 | 17 |
| 2022.09.08. 21:30 | 17 |
| 2022.09.08. 21:45 | 17 |
| 2022.09.08. 22:00 | 17 |
| 2022.09.08. 22:15 | 17 |
| 2022.09.08. 22:30 | 17 |
| 2022.09.08. 22:45 | 17 |
| 2022.09.08. 23:00 | 17 |
| 2022.09.08. 23:15 | 17 |
| 2022.09.08. 23:30 | 17 |
| 2022.09.08. 23:45 | 17 |
| 2022.09.09. 00:00 | 17 |
| 2022.09.09. 00:15 | 17 |
| 2022.09.09. 00:30 | 17 |
| 2022.09.09. 00:45 | 17 |
| 2022.09.09. 01:00 | 17 |
| 2022.09.09. 01:15 | 17 |
| 2022.09.09. 01:30 | 17 |
| 2022.09.09. 01:45 | 17 |
| 2022.09.09. 02:00 | 17 |
| 2022.09.09. 02:15 | 17 |
| 2022.09.09. 02:30 | 17 |
| 2022.09.09. 02:45 | 17 |
| 2022.09.09. 03:00 | 17 |
| 2022.09.09. 03:15 | 17 |
| 2022.09.09. 03:30 | 17 |
| 2022.09.09. 03:45 | 17 |
| 2022.09.09. 04:00 | 17 |
| 2022.09.09. 04:15 | 17 |
| 2022.09.09. 04:30 | 17 |
| 2022.09.09. 04:45 | 17 |
| 2022.09.09. 05:00 | 17 |
| 2022.09.09. 05:15 | 17 |
| 2022.09.09. 05:30 | 17 |
| 2022.09.09. 05:45 | 17 |
| 2022.09.09. 06:00 | 17 |
| 2022.09.09. 06:15 | 17 |
| 2022.09.09. 06:30 | 17 |
| 2022.09.09. 06:45 | 17 |
| 2022.09.09. 07:00 | 17 |
| 2022.09.09. 07:15 | 17 |
| 2022.09.09. 07:30 | 17 |
| 2022.09.09. 07:45 | 17 |
| 2022.09.09. 08:00 | 17 |
| 2022.09.09. 08:15 | 17 |
| 2022.09.09. 08:30 | 17 |
| 2022.09.09. 08:45 | 17 |
| 2022.09.09. 09:00 | 17 |
| 2022.09.09. 09:15 | 17 |
| 2022.09.09. 09:30 | 17 |
| 2022.09.09. 09:45 | 17 |
| 2022.09.09. 10:00 | 17 |
| 2022.09.09. 10:15 | 17 |
| 2022.09.09. 10:30 | 17 |
| 2022.09.09. 10:45 | 17 |
| 2022.09.09. 11:00 | 17 |
| 2022.09.09. 11:15 | 17 |
| 2022.09.09. 11:30 | 17 |
| 2022.09.09. 11:45 | 17 |
| 2022.09.09. 12:00 | 17 |
| 2022.09.09. 12:15 | 17 |
| 2022.09.09. 12:30 | 17 |
| 2022.09.09. 12:45 | 17 |
| 2022.09.09. 13:00 | 17 |
| 2022.09.09. 13:15 | 17 |
| 2022.09.09. 13:30 | 17 |
| 2022.09.09. 13:45 | 17 |
| 2022.09.09. 14:00 | 17 |
| 2022.09.09. 14:15 | 17 |
| 2022.09.09. 14:30 | 17 |
| 2022.09.09. 14:45 | 17 |
| 2022.09.09. 15:00 | 17 |
| 2022.09.09. 15:15 | 17 |
| 2022.09.09. 15:30 | 17 |
| 2022.09.09. 15:45 | 17 |
| 2022.09.09. 16:00 | 17 |
| 2022.09.09. 16:15 | 17 |
| 2022.09.09. 16:30 | 17 |
| 2022.09.09. 16:45 | 17 |
| 2022.09.09. 17:00 | 17 |
| 2022.09.09. 17:15 | 17 |
| 2022.09.09. 17:30 | 17 |
| 2022.09.09. 17:45 | 17 |
| 2022.09.09. 18:00 | 17 |
| 2022.09.09. 18:15 | 17 |
| 2022.09.09. 18:30 | 17 |
| 2022.09.09. 18:45 | 17 |
| 2022.09.09. 19:00 | 17 |
| 2022.09.09. 19:15 | 17 |
| 2022.09.09. 19:30 | 17 |
| 2022.09.09. 19:45 | 17 |
| 2022.09.09. 20:00 | 17 |
| 2022.09.09. 20:15 | 17 |
| 2022.09.09. 20:30 | 17 |
| 2022.09.09. 20:45 | 17 |
| 2022.09.09. 21:00 | 17 |
| 2022.09.09. 21:15 | 17 |
| 2022.09.09. 21:30 | 17 |
| 2022.09.09. 21:45 | 17 |
| 2022.09.09. 22:00 | 17 |
| 2022.09.09. 22:15 | 17 |
| 2022.09.09. 22:30 | 17 |
| 2022.09.09. 22:45 | 17 |
| 2022.09.09. 23:00 | 17 |
| 2022.09.09. 23:15 | 17 |
| 2022.09.09. 23:30 | 17 |
| 2022.09.09. 23:45 | 17 |
| 2022.09.10. 00:00 | 17 |
| 2022.09.10. 00:15 | 17 |
| 2022.09.10. 00:30 | 17 |
| 2022.09.10. 00:45 | 17 |
| 2022.09.10. 01:00 | 17 |
| 2022.09.10. 01:15 | 17 |
| 2022.09.10. 01:30 | 17 |
| 2022.09.10. 01:45 | 17 |
| 2022.09.10. 02:00 | 17 |
| 2022.09.10. 02:15 | 17 |
| 2022.09.10. 02:30 | 17 |
| 2022.09.10. 02:45 | 17 |
| 2022.09.10. 03:00 | 17 |
| 2022.09.10. 03:15 | 17 |
| 2022.09.10. 03:30 | 17 |
| 2022.09.10. 03:45 | 17 |
| 2022.09.10. 04:00 | 17 |
| 2022.09.10. 04:15 | 17 |
| 2022.09.10. 04:30 | 17 |
| 2022.09.10. 04:45 | 17 |
| 2022.09.10. 05:00 | 17 |
| 2022.09.10. 05:15 | 17 |
| 2022.09.10. 05:30 | 17 |
| 2022.09.10. 05:45 | 17 |
| 2022.09.10. 06:00 | 17 |
| 2022.09.10. 06:15 | 17 |
| 2022.09.10. 06:30 | 17 |
| 2022.09.10. 06:45 | 17 |
| 2022.09.10. 07:00 | 17 |
| 2022.09.10. 07:15 | 17 |
| 2022.09.10. 07:30 | 17 |
| 2022.09.10. 07:45 | 17 |
| 2022.09.10. 08:00 | 17 |
| 2022.09.10. 08:15 | 17 |
| 2022.09.10. 08:30 | 17 |
| 2022.09.10. 08:45 | 17 |
| 2022.09.10. 09:00 | 17 |
| 2022.09.10. 09:15 | 17 |
| 2022.09.10. 09:30 | 17 |
| 2022.09.10. 09:45 | 17 |
| 2022.09.10. 10:00 | 17 |
| 2022.09.10. 10:15 | 17 |
| 2022.09.10. 10:30 | 17 |
| 2022.09.10. 10:45 | 17 |
| 2022.09.10. 11:00 | 17 |
| 2022.09.10. 11:15 | 17 |
| 2022.09.10. 11:30 | 17 |
| 2022.09.10. 11:45 | 17 |
| 2022.09.10. 12:00 | 17 |
| 2022.09.10. 12:15 | 17 |
| 2022.09.10. 12:30 | 17 |
| 2022.09.10. 12:45 | 17 |
| 2022.09.10. 13:00 | 17 |
| 2022.09.10. 13:15 | 17 |
| 2022.09.10. 13:30 | 17 |
| 2022.09.10. 13:45 | 17 |
| 2022.09.10. 14:00 | 17 |
| 2022.09.10. 14:15 | 17 |
| 2022.09.10. 14:30 | 17 |
| 2022.09.10. 14:45 | 17 |
| 2022.09.10. 15:00 | 17 |
| 2022.09.10. 15:15 | 17 |
| 2022.09.10. 15:30 | 17 |
| 2022.09.10. 15:45 | 17 |
| 2022.09.10. 16:00 | 17 |
| 2022.09.10. 16:15 | 17 |
| 2022.09.10. 16:30 | 17 |
| 2022.09.10. 16:45 | 17 |
| 2022.09.10. 17:00 | 17 |
| 2022.09.10. 17:15 | 17 |
| 2022.09.10. 17:30 | 17 |
| 2022.09.10. 17:45 | 17 |
| 2022.09.10. 18:00 | 17 |
| 2022.09.10. 18:15 | 17 |
| 2022.09.10. 18:30 | 17 |
| 2022.09.10. 18:45 | 17 |
| 2022.09.10. 19:00 | 17 |
| 2022.09.10. 19:15 | 17 |
| 2022.09.10. 19:30 | 17 |
| 2022.09.10. 19:45 | 17 |
| 2022.09.10. 20:00 | 17 |
| 2022.09.10. 20:15 | 17 |
| 2022.09.10. 20:30 | 17 |
| 2022.09.10. 20:45 | 17 |
| 2022.09.10. 21:00 | 17 |
| 2022.09.10. 21:15 | 17 |
| 2022.09.10. 21:30 | 17 |
| 2022.09.10. 21:45 | 17 |
| 2022.09.10. 22:00 | 17 |
| 2022.09.10. 22:15 | 17 |
| 2022.09.10. 22:30 | 17 |
| 2022.09.10. 22:45 | 17 |
| 2022.09.10. 23:00 | 17 |
| 2022.09.10. 23:15 | 17 |
| 2022.09.10. 23:30 | 17 |
| 2022.09.10. 23:45 | 17 |
| 2022.09.11. 00:00 | 17 |
| 2022.09.11. 00:15 | 17 |
| 2022.09.11. 00:30 | 17 |
| 2022.09.11. 00:45 | 17 |
| 2022.09.11. 01:00 | 17 |
| 2022.09.11. 01:15 | 17 |
| 2022.09.11. 01:30 | 17 |
| 2022.09.11. 01:45 | 17 |
| 2022.09.11. 02:00 | 17 |
| 2022.09.11. 02:15 | 17 |
| 2022.09.11. 02:30 | 17 |
| 2022.09.11. 02:45 | 17 |
| 2022.09.11. 03:00 | 17 |
| 2022.09.11. 03:15 | 17 |
| 2022.09.11. 03:30 | 17 |
| 2022.09.11. 03:45 | 17 |
| 2022.09.11. 04:00 | 17 |
| 2022.09.11. 04:15 | 17 |
| 2022.09.11. 04:30 | 17 |
| 2022.09.11. 04:45 | 17 |
| 2022.09.11. 05:00 | 17 |
| 2022.09.11. 05:15 | 17 |
| 2022.09.11. 05:30 | 17 |
| 2022.09.11. 05:45 | 17 |
| 2022.09.11. 06:00 | 17 |
| 2022.09.11. 06:15 | 17 |
| 2022.09.11. 06:30 | 17 |
| 2022.09.11. 06:45 | 17 |
| 2022.09.11. 07:00 | 17 |
| 2022.09.11. 07:15 | 17 |
| 2022.09.11. 07:30 | 17 |
| 2022.09.11. 07:45 | 17 |
| 2022.09.11. 08:00 | 17 |
| 2022.09.11. 08:15 | 17 |
| 2022.09.11. 08:30 | 17 |
| 2022.09.11. 08:45 | 17 |
| 2022.09.11. 09:00 | 17 |
| 2022.09.11. 09:15 | 17 |
| 2022.09.11. 09:30 | 17 |
| 2022.09.11. 09:45 | 17 |
| 2022.09.11. 10:00 | 17 |
| 2022.09.11. 10:15 | 17 |
| 2022.09.11. 10:30 | 17 |
| 2022.09.11. 10:45 | 17 |
| 2022.09.11. 11:00 | 17 |
| 2022.09.11. 11:15 | 17 |
| 2022.09.11. 11:30 | 17 |
| 2022.09.11. 11:45 | 17 |
| 2022.09.11. 12:00 | 17 |
| 2022.09.11. 12:15 | 17 |
| 2022.09.11. 12:30 | 17 |
| 2022.09.11. 12:45 | 17 |
| 2022.09.11. 13:00 | 17 |
| 2022.09.11. 13:15 | 17 |
| 2022.09.11. 13:30 | 17 |
| 2022.09.11. 13:45 | 17 |
| 2022.09.11. 14:00 | 17 |
| 2022.09.11. 14:15 | 17 |
| 2022.09.11. 14:30 | 17 |
| 2022.09.11. 14:45 | 17 |
| 2022.09.11. 15:00 | 17 |
| 2022.09.11. 15:15 | 17 |
| 2022.09.11. 15:30 | 17 |
| 2022.09.11. 15:45 | 17 |
| 2022.09.11. 16:00 | 17 |
| 2022.09.11. 16:15 | 17 |
| 2022.09.11. 16:30 | 17 |
| 2022.09.11. 16:45 | 17 |
| 2022.09.11. 17:00 | 17 |
| 2022.09.11. 17:15 | 17 |
| 2022.09.11. 17:30 | 17 |
| 2022.09.11. 17:45 | 17 |
| 2022.09.11. 18:00 | 17 |
| 2022.09.11. 18:15 | 17 |
| 2022.09.11. 18:30 | 17 |
| 2022.09.11. 18:45 | 17 |
| 2022.09.11. 19:00 | 17 |
| 2022.09.11. 19:15 | 17 |
| 2022.09.11. 19:30 | 17 |
| 2022.09.11. 19:45 | 17 |
| 2022.09.11. 20:00 | 17 |
| 2022.09.11. 20:15 | 17 |
| 2022.09.11. 20:30 | 17 |
| 2022.09.11. 20:45 | 17 |
| 2022.09.11. 21:00 | 17 |
| 2022.09.11. 21:15 | 17 |
| 2022.09.11. 21:30 | 17 |
| 2022.09.11. 21:45 | 17 |
| 2022.09.11. 22:00 | 17 |
| 2022.09.11. 22:15 | 17 |
| 2022.09.11. 22:30 | 17 |
| 2022.09.11. 22:45 | 17 |
| 2022.09.11. 23:00 | 17 |
| 2022.09.11. 23:15 | 17 |
| 2022.09.11. 23:30 | 17 |
| 2022.09.11. 23:45 | 17 |
| 2022.09.12. 00:00 | 17 |
| 2022.09.12. 00:15 | 17 |
| 2022.09.12. 00:30 | 17 |
| 2022.09.12. 00:45 | 17 |
| 2022.09.12. 01:00 | 17 |
| 2022.09.12. 01:15 | 17 |
| 2022.09.12. 01:30 | 17 |
| 2022.09.12. 01:45 | 17 |
| 2022.09.12. 02:00 | 17 |
| 2022.09.12. 02:15 | 17 |
| 2022.09.12. 02:30 | 17 |
| 2022.09.12. 02:45 | 17 |
| 2022.09.12. 03:00 | 17 |
| 2022.09.12. 03:15 | 17 |
| 2022.09.12. 03:30 | 17 |
| 2022.09.12. 03:45 | 17 |
| 2022.09.12. 04:00 | 17 |
| 2022.09.12. 04:15 | 17 |
| 2022.09.12. 04:30 | 17 |
| 2022.09.12. 04:45 | 17 |
| 2022.09.12. 05:00 | 17 |
| 2022.09.12. 05:15 | 17 |
| 2022.09.12. 05:30 | 17 |
| 2022.09.12. 05:45 | 17 |
| 2022.09.12. 06:00 | 17 |
| 2022.09.12. 06:15 | 17 |
| 2022.09.12. 06:30 | 17 |
| 2022.09.12. 06:45 | 17 |
| 2022.09.12. 07:00 | 17 |
| 2022.09.12. 07:15 | 17 |
| 2022.09.12. 07:30 | 17 |
| 2022.09.12. 07:45 | 17 |
| 2022.09.12. 08:00 | 17 |
| 2022.09.12. 08:15 | 17 |
| 2022.09.12. 08:30 | 17 |
| 2022.09.12. 08:45 | 17 |
| 2022.09.12. 09:00 | 17 |
| 2022.09.12. 09:15 | 17 |
| 2022.09.12. 09:30 | 17 |
| 2022.09.12. 09:45 | 17 |
| 2022.09.12. 10:00 | 17 |
| 2022.09.12. 10:15 | 17 |
| 2022.09.12. 10:30 | 17 |
| 2022.09.12. 10:45 | 17 |
| 2022.09.12. 11:00 | 17 |
| 2022.09.12. 11:15 | 17 |
| 2022.09.12. 11:30 | 17 |
| 2022.09.12. 11:45 | 17 |
| 2022.09.12. 12:00 | 17 |
| 2022.09.12. 12:15 | 17 |
| 2022.09.12. 12:30 | 17 |
| 2022.09.12. 12:45 | 17 |
| 2022.09.12. 13:00 | 17 |
| 2022.09.12. 13:15 | 17 |
| 2022.09.12. 13:30 | 17 |
| 2022.09.12. 13:45 | 17 |
| 2022.09.12. 14:00 | 17 |
| 2022.09.12. 14:15 | 17 |
| 2022.09.12. 14:30 | 17 |
| 2022.09.12. 14:45 | 17 |
| 2022.09.12. 15:00 | 17 |
| 2022.09.12. 15:15 | 17 |
| 2022.09.12. 15:30 | 17 |
| 2022.09.12. 15:45 | 17 |
| 2022.09.12. 16:00 | 17 |
| 2022.09.12. 16:15 | 17 |
| 2022.09.12. 16:30 | 17 |
| 2022.09.12. 16:45 | 17 |
| 2022.09.12. 17:00 | 17 |
| 2022.09.12. 17:15 | 17 |
| 2022.09.12. 17:30 | 17 |
| 2022.09.12. 17:45 | 17 |
| 2022.09.12. 18:00 | 17 |
| 2022.09.12. 18:15 | 17 |
| 2022.09.12. 18:30 | 17 |
| 2022.09.12. 18:45 | 17 |
| 2022.09.12. 19:00 | 17 |
| 2022.09.12. 19:15 | 17 |
| 2022.09.12. 19:30 | 17 |
| 2022.09.12. 19:45 | 17 |
| 2022.09.12. 20:00 | 17 |
| 2022.09.12. 20:15 | 17 |
| 2022.09.12. 20:30 | 17 |
| 2022.09.12. 20:45 | 17 |
| 2022.09.12. 21:00 | 17 |
| 2022.09.12. 21:15 | 17 |
| 2022.09.12. 21:30 | 17 |
| 2022.09.12. 21:45 | 17 |
| 2022.09.12. 22:00 | 17 |
| 2022.09.12. 22:15 | 17 |
| 2022.09.12. 22:30 | 17 |
| 2022.09.12. 22:45 | 17 |
| 2022.09.12. 23:00 | 17 |
| 2022.09.12. 23:15 | 17 |
| 2022.09.12. 23:30 | 17 |
| 2022.09.12. 23:45 | 17 |
| 2022.09.13. 00:00 | 17 |
| 2022.09.13. 00:15 | 17 |
| 2022.09.13. 00:30 | 17 |
| 2022.09.13. 00:45 | 17 |
| 2022.09.13. 01:00 | 17 |
| 2022.09.13. 01:15 | 17 |
| 2022.09.13. 01:30 | 17 |
| 2022.09.13. 01:45 | 17 |
| 2022.09.13. 02:00 | 17 |
| 2022.09.13. 02:15 | 17 |
| 2022.09.13. 02:30 | 17 |
| 2022.09.13. 02:45 | 17 |
| 2022.09.13. 03:00 | 17 |
| 2022.09.13. 03:15 | 17 |
| 2022.09.13. 03:30 | 17 |
| 2022.09.13. 03:45 | 17 |
| 2022.09.13. 04:00 | 17 |
| 2022.09.13. 04:15 | 17 |
| 2022.09.13. 04:30 | 17 |
| 2022.09.13. 04:45 | 17 |
| 2022.09.13. 05:00 | 17 |
| 2022.09.13. 05:15 | 17 |
| 2022.09.13. 05:30 | 17 |
| 2022.09.13. 05:45 | 17 |
| 2022.09.13. 06:00 | 17 |
| 2022.09.13. 06:15 | 17 |
| 2022.09.13. 06:30 | 17 |
| 2022.09.13. 06:45 | 17 |
| 2022.09.13. 07:00 | 17 |
| 2022.09.13. 07:15 | 17 |
| 2022.09.13. 07:30 | 17 |
| 2022.09.13. 07:45 | 17 |
| 2022.09.13. 08:00 | 17 |
| 2022.09.13. 08:15 | 17 |
| 2022.09.13. 08:30 | 17 |
| 2022.09.13. 08:45 | 17 |
| 2022.09.13. 09:00 | 17 |
| 2022.09.13. 09:15 | 17 |
| 2022.09.13. 09:30 | 17 |
| 2022.09.13. 09:45 | 17 |
| 2022.09.13. 10:00 | 17 |
| 2022.09.13. 10:15 | 17 |
| 2022.09.13. 10:30 | 17 |
| 2022.09.13. 10:45 | 17 |
| 2022.09.13. 11:00 | 17 |
| 2022.09.13. 11:15 | 17 |
| 2022.09.13. 11:30 | 17 |
| 2022.09.13. 11:45 | 17 |
| 2022.09.13. 12:00 | 17 |
| 2022.09.13. 12:15 | 17 |
| 2022.09.13. 12:30 | 17 |
| 2022.09.13. 12:45 | 17 |
| 2022.09.13. 13:00 | 17 |
| 2022.09.13. 13:15 | 17 |
| 2022.09.13. 13:30 | 17 |
| 2022.09.13. 13:45 | 17 |
| 2022.09.13. 14:00 | 17 |
| 2022.09.13. 14:15 | 17 |
| 2022.09.13. 14:30 | 17 |
| 2022.09.13. 14:45 | 17 |
| 2022.09.13. 15:00 | 17 |
| 2022.09.13. 15:15 | 17 |
| 2022.09.13. 15:30 | 17 |
| 2022.09.13. 15:45 | 17 |
| 2022.09.13. 16:00 | 17 |
| 2022.09.13. 16:15 | 17 |
| 2022.09.13. 16:30 | 17 |
| 2022.09.13. 16:45 | 17 |
| 2022.09.13. 17:00 | 17 |
| 2022.09.13. 17:15 | 17 |
| 2022.09.13. 17:30 | 17 |
| 2022.09.13. 17:45 | 17 |
| 2022.09.13. 18:00 | 17 |
| 2022.09.13. 18:15 | 17 |
| 2022.09.13. 18:30 | 17 |
| 2022.09.13. 18:45 | 17 |
| 2022.09.13. 19:00 | 17 |
| 2022.09.13. 19:15 | 17 |
| 2022.09.13. 19:30 | 17 |
| 2022.09.13. 19:45 | 17 |
| 2022.09.13. 20:00 | 17 |
| 2022.09.13. 20:15 | 17 |
| 2022.09.13. 20:30 | 17 |
| 2022.09.13. 20:45 | 17 |
| 2022.09.13. 21:00 | 17 |
| 2022.09.13. 21:15 | 17 |
| 2022.09.13. 21:30 | 17 |
| 2022.09.13. 21:45 | 17 |
| 2022.09.13. 22:00 | 17 |
| 2022.09.13. 22:15 | 17 |
| 2022.09.13. 22:30 | 17 |
| 2022.09.13. 22:45 | 17 |
| 2022.09.13. 23:00 | 17 |
| 2022.09.13. 23:15 | 17 |
| 2022.09.13. 23:30 | 17 |
| 2022.09.13. 23:45 | 17 |
| 2022.09.14. 00:00 | 17 |
| 2022.09.14. 00:15 | 17 |
| 2022.09.14. 00:30 | 17 |
| 2022.09.14. 00:45 | 17 |
| 2022.09.14. 01:00 | 17 |
| 2022.09.14. 01:15 | 17 |
| 2022.09.14. 01:30 | 17 |
| 2022.09.14. 01:45 | 17 |
| 2022.09.14. 02:00 | 17 |
| 2022.09.14. 02:15 | 17 |
| 2022.09.14. 02:30 | 17 |
| 2022.09.14. 02:45 | 17 |
| 2022.09.14. 03:00 | 17 |
| 2022.09.14. 03:15 | 17 |
| 2022.09.14. 03:30 | 17 |
| 2022.09.14. 03:45 | 17 |
| 2022.09.14. 04:00 | 17 |
| 2022.09.14. 04:15 | 17 |
| 2022.09.14. 04:30 | 17 |
| 2022.09.14. 04:45 | 17 |
| 2022.09.14. 05:00 | 17 |
| 2022.09.14. 05:15 | 17 |
| 2022.09.14. 05:30 | 17 |
| 2022.09.14. 05:45 | 17 |
| 2022.09.14. 06:00 | 17 |
| 2022.09.14. 06:15 | 17 |
| 2022.09.14. 06:30 | 17 |
| 2022.09.14. 06:45 | 17 |
| 2022.09.14. 07:00 | 17 |
| 2022.09.14. 07:15 | 17 |
| 2022.09.14. 07:30 | 17 |
| 2022.09.14. 07:45 | 17 |
| 2022.09.14. 08:00 | 17 |
| 2022.09.14. 08:15 | 17 |
| 2022.09.14. 08:30 | 17 |
| 2022.09.14. 08:45 | 17 |
| 2022.09.14. 09:00 | 17 |
| 2022.09.14. 09:15 | 17 |
| 2022.09.14. 09:30 | 17 |
| 2022.09.14. 09:45 | 17 |
| 2022.09.14. 10:00 | 17 |
| 2022.09.14. 10:15 | 17 |
| 2022.09.14. 10:30 | 17 |
| 2022.09.14. 10:45 | 17 |
| 2022.09.14. 11:00 | 17 |
| 2022.09.14. 11:15 | 17 |
| 2022.09.14. 11:30 | 17 |
| 2022.09.14. 11:45 | 17 |
| 2022.09.14. 12:00 | 17 |
| 2022.09.14. 12:15 | 17 |
| 2022.09.14. 12:30 | 17 |
| 2022.09.14. 12:45 | 17 |
| 2022.09.14. 13:00 | 17 |
| 2022.09.14. 13:15 | 17 |
| 2022.09.14. 13:30 | 17 |
| 2022.09.14. 13:45 | 17 |
| 2022.09.14. 14:00 | 17 |
| 2022.09.14. 14:15 | 17 |
| 2022.09.14. 14:30 | 17 |
| 2022.09.14. 14:45 | 17 |
| 2022.09.14. 15:00 | 17 |
| 2022.09.14. 15:15 | 17 |
| 2022.09.14. 15:30 | 17 |
| 2022.09.14. 15:45 | 17 |
| 2022.09.14. 16:00 | 17 |
| 2022.09.14. 16:15 | 17 |
| 2022.09.14. 16:30 | 17 |
| 2022.09.14. 16:45 | 17 |
| 2022.09.14. 17:00 | 17 |
| 2022.09.14. 17:15 | 17 |
| 2022.09.14. 17:30 | 17 |
| 2022.09.14. 17:45 | 17 |
| 2022.09.14. 18:00 | 17 |
| 2022.09.14. 18:15 | 17 |
| 2022.09.14. 18:30 | 17 |
| 2022.09.14. 18:45 | 17 |
| 2022.09.14. 19:00 | 17 |
| 2022.09.14. 19:15 | 17 |
| 2022.09.14. 19:30 | 17 |
| 2022.09.14. 19:45 | 17 |
| 2022.09.14. 20:00 | 17 |
| 2022.09.14. 20:15 | 17 |
| 2022.09.14. 20:30 | 17 |
| 2022.09.14. 20:45 | 17 |
| 2022.09.14. 21:00 | 17 |
| 2022.09.14. 21:15 | 17 |
| 2022.09.14. 21:30 | 17 |
| 2022.09.14. 21:45 | 17 |
| 2022.09.14. 22:00 | 17 |
| 2022.09.14. 22:15 | 17 |
| 2022.09.14. 22:30 | 17 |
| 2022.09.14. 22:45 | 17 |
| 2022.09.14. 23:00 | 17 |
| 2022.09.14. 23:15 | 17 |
| 2022.09.14. 23:30 | 17 |
| 2022.09.14. 23:45 | 17 |
| 2022.09.15. 00:00 | 17 |
| 2022.09.15. 00:15 | 17 |
| 2022.09.15. 00:30 | 17 |
| 2022.09.15. 00:45 | 17 |
| 2022.09.15. 01:00 | 17 |
| 2022.09.15. 01:15 | 17 |
| 2022.09.15. 01:30 | 17 |
| 2022.09.15. 01:45 | 17 |
| 2022.09.15. 02:00 | 17 |
| 2022.09.15. 02:15 | 17 |
| 2022.09.15. 02:30 | 17 |
| 2022.09.15. 02:45 | 17 |
| 2022.09.15. 03:00 | 17 |
| 2022.09.15. 03:15 | 17 |
| 2022.09.15. 03:30 | 17 |
| 2022.09.15. 03:45 | 17 |
| 2022.09.15. 04:00 | 17 |
| 2022.09.15. 04:15 | 17 |
| 2022.09.15. 04:30 | 17 |
| 2022.09.15. 04:45 | 17 |
| 2022.09.15. 05:00 | 17 |
| 2022.09.15. 05:15 | 17 |
| 2022.09.15. 05:30 | 17 |
| 2022.09.15. 05:45 | 17 |
| 2022.09.15. 06:00 | 17 |
| 2022.09.15. 06:15 | 17 |
| 2022.09.15. 06:30 | 17 |
| 2022.09.15. 06:45 | 17 |
| 2022.09.15. 07:00 | 17 |
| 2022.09.15. 07:15 | 17 |
| 2022.09.15. 07:30 | 17 |
| 2022.09.15. 07:45 | 17 |
| 2022.09.15. 08:00 | 17 |
| 2022.09.15. 08:15 | 17 |
| 2022.09.15. 08:30 | 17 |
| 2022.09.15. 08:45 | 17 |
| 2022.09.15. 09:00 | 17 |
| 2022.09.15. 09:15 | 17 |
| 2022.09.15. 09:30 | 17 |
| 2022.09.15. 09:45 | 17 |
| 2022.09.15. 10:00 | 17 |
| 2022.09.15. 10:15 | 17 |
| 2022.09.15. 10:30 | 17 |
| 2022.09.15. 10:45 | 17 |
| 2022.09.15. 11:00 | 17 |
| 2022.09.15. 11:15 | 17 |
| 2022.09.15. 11:30 | 17 |
| 2022.09.15. 11:45 | 17 |
| 2022.09.15. 12:00 | 17 |
| 2022.09.15. 12:15 | 17 |
| 2022.09.15. 12:30 | 17 |
| 2022.09.15. 12:45 | 17 |
| 2022.09.15. 13:00 | 17 |
| 2022.09.15. 13:15 | 17 |
| 2022.09.15. 13:30 | 17 |
| 2022.09.15. 13:45 | 17 |
| 2022.09.15. 14:00 | 17 |
| 2022.09.15. 14:15 | 17 |
| 2022.09.15. 14:30 | 17 |
| 2022.09.15. 14:45 | 17 |
| 2022.09.15. 15:00 | 17 |
| 2022.09.15. 15:15 | 17 |
| 2022.09.15. 15:30 | 17 |
| 2022.09.15. 15:45 | 17 |
| 2022.09.15. 16:00 | 17 |
| 2022.09.15. 16:15 | 17 |
| 2022.09.15. 16:30 | 17 |
| 2022.09.15. 16:45 | 17 |
| 2022.09.15. 17:00 | 17 |
| 2022.09.15. 17:15 | 17 |
| 2022.09.15. 17:30 | 17 |
| 2022.09.15. 17:45 | 17 |
| 2022.09.15. 18:00 | 17 |
| 2022.09.15. 18:15 | 17 |
| 2022.09.15. 18:30 | 17 |
| 2022.09.15. 18:45 | 17 |
| 2022.09.15. 19:00 | 17 |
| 2022.09.15. 19:15 | 17 |
| 2022.09.15. 19:30 | 17 |
| 2022.09.15. 19:45 | 17 |
| 2022.09.15. 20:00 | 17 |
| 2022.09.15. 20:15 | 17 |
| 2022.09.15. 20:30 | 17 |
| 2022.09.15. 20:45 | 17 |
| 2022.09.15. 21:00 | 17 |
| 2022.09.15. 21:15 | 17 |
| 2022.09.15. 21:30 | 17 |
| 2022.09.15. 21:45 | 17 |
| 2022.09.15. 22:00 | 17 |
| 2022.09.15. 22:15 | 17 |
| 2022.09.15. 22:30 | 17 |
| 2022.09.15. 22:45 | 17 |
| 2022.09.15. 23:00 | 17 |
| 2022.09.15. 23:15 | 17 |
| 2022.09.15. 23:30 | 17 |
| 2022.09.15. 23:45 | 17 |
| 2022.09.16. 00:00 | 17 |
| 2022.09.16. 00:15 | 17 |
| 2022.09.16. 00:30 | 17 |
| 2022.09.16. 00:45 | 17 |
| 2022.09.16. 01:00 | 17 |
| 2022.09.16. 01:15 | 17 |
| 2022.09.16. 01:30 | 17 |
| 2022.09.16. 01:45 | 17 |
| 2022.09.16. 02:00 | 17 |
| 2022.09.16. 02:15 | 17 |
| 2022.09.16. 02:30 | 17 |
| 2022.09.16. 02:45 | 17 |
| 2022.09.16. 03:00 | 17 |
| 2022.09.16. 03:15 | 17 |
| 2022.09.16. 03:30 | 17 |
| 2022.09.16. 03:45 | 17 |
| 2022.09.16. 04:00 | 17 |
| 2022.09.16. 04:15 | 17 |
| 2022.09.16. 04:30 | 17 |
| 2022.09.16. 04:45 | 17 |
| 2022.09.16. 05:00 | 17 |
| 2022.09.16. 05:15 | 17 |
| 2022.09.16. 05:30 | 17 |
| 2022.09.16. 05:45 | 17 |
| 2022.09.16. 06:00 | 17 |
| 2022.09.16. 06:15 | 17 |
| 2022.09.16. 06:30 | 17 |
| 2022.09.16. 06:45 | 17 |
| 2022.09.16. 07:00 | 17 |
| 2022.09.16. 07:15 | 17 |
| 2022.09.16. 07:30 | 17 |
| 2022.09.16. 07:45 | 17 |
| 2022.09.16. 08:00 | 17 |
| 2022.09.16. 08:15 | 17 |
| 2022.09.16. 08:30 | 17 |
| 2022.09.16. 08:45 | 17 |
| 2022.09.16. 09:00 | 17 |
| 2022.09.16. 09:15 | 17 |
| 2022.09.16. 09:30 | 17 |
| 2022.09.16. 09:45 | 17 |
| 2022.09.16. 10:00 | 17 |
| 2022.09.16. 10:15 | 17 |
| 2022.09.16. 10:30 | 17 |
| 2022.09.16. 10:45 | 17 |
| 2022.09.16. 11:00 | 17 |
| 2022.09.16. 11:15 | 17 |
| 2022.09.16. 11:30 | 17 |
| 2022.09.16. 11:45 | 17 |
| 2022.09.16. 12:00 | 17 |
| 2022.09.16. 12:15 | 17 |
| 2022.09.16. 12:30 | 17 |
| 2022.09.16. 12:45 | 17 |
| 2022.09.16. 13:00 | 17 |
| 2022.09.16. 13:15 | 17 |
| 2022.09.16. 13:30 | 17 |
| 2022.09.16. 13:45 | 17 |
| 2022.09.16. 14:00 | 17 |
| 2022.09.16. 14:15 | 17 |
| 2022.09.16. 14:30 | 17 |
| 2022.09.16. 14:45 | 17 |
| 2022.09.16. 15:00 | 17 |
| 2022.09.16. 15:15 | 17 |
| 2022.09.16. 15:30 | 17 |
| 2022.09.16. 15:45 | 17 |
| 2022.09.16. 16:00 | 17 |
| 2022.09.16. 16:15 | 17 |
| 2022.09.16. 16:30 | 17 |
| 2022.09.16. 16:45 | 17 |
| 2022.09.16. 17:00 | 17 |
| 2022.09.16. 17:15 | 17 |
| 2022.09.16. 17:30 | 17 |
| 2022.09.16. 17:45 | 17 |
| 2022.09.16. 18:00 | 17 |
| 2022.09.16. 18:15 | 17 |
| 2022.09.16. 18:30 | 17 |
| 2022.09.16. 18:45 | 17 |
| 2022.09.16. 19:00 | 17 |
| 2022.09.16. 19:15 | 17 |
| 2022.09.16. 19:30 | 17 |
| 2022.09.16. 19:45 | 17 |
| 2022.09.16. 20:00 | 17 |
| 2022.09.16. 20:15 | 17 |
| 2022.09.16. 20:30 | 17 |
| 2022.09.16. 20:45 | 17 |
| 2022.09.16. 21:00 | 17 |
| 2022.09.16. 21:15 | 17 |
| 2022.09.16. 21:30 | 17 |
| 2022.09.16. 21:45 | 17 |
| 2022.09.16. 22:00 | 17 |
| 2022.09.16. 22:15 | 17 |
| 2022.09.16. 22:30 | 17 |
| 2022.09.16. 22:45 | 17 |
| 2022.09.16. 23:00 | 17 |
| 2022.09.16. 23:15 | 17 |
| 2022.09.16. 23:30 | 17 |
| 2022.09.16. 23:45 | 17 |
| 2022.09.17. 00:00 | 17 |
| 2022.09.17. 00:15 | 17 |
| 2022.09.17. 00:30 | 17 |
| 2022.09.17. 00:45 | 17 |
| 2022.09.17. 01:00 | 17 |
| 2022.09.17. 01:15 | 17 |
| 2022.09.17. 01:30 | 17 |
| 2022.09.17. 01:45 | 17 |
| 2022.09.17. 02:00 | 17 |
| 2022.09.17. 02:15 | 17 |
| 2022.09.17. 02:30 | 17 |
| 2022.09.17. 02:45 | 17 |
| 2022.09.17. 03:00 | 17 |
| 2022.09.17. 03:15 | 17 |
| 2022.09.17. 03:30 | 17 |
| 2022.09.17. 03:45 | 17 |
| 2022.09.17. 04:00 | 17 |
| 2022.09.17. 04:15 | 17 |
| 2022.09.17. 04:30 | 17 |
| 2022.09.17. 04:45 | 17 |
| 2022.09.17. 05:00 | 17 |
| 2022.09.17. 05:15 | 17 |
| 2022.09.17. 05:30 | 17 |
| 2022.09.17. 05:45 | 17 |
| 2022.09.17. 06:00 | 17 |
| 2022.09.17. 06:15 | 17 |
| 2022.09.17. 06:30 | 17 |
| 2022.09.17. 06:45 | 17 |
| 2022.09.17. 07:00 | 17 |
| 2022.09.17. 07:15 | 17 |
| 2022.09.17. 07:30 | 17 |
| 2022.09.17. 07:45 | 17 |
| 2022.09.17. 08:00 | 17 |
| 2022.09.17. 08:15 | 17 |
| 2022.09.17. 08:30 | 17 |
| 2022.09.17. 08:45 | 17 |
| 2022.09.17. 09:00 | 17 |
| 2022.09.17. 09:15 | 17 |
| 2022.09.17. 09:30 | 17 |
| 2022.09.17. 09:45 | 17 |
| 2022.09.17. 10:00 | 17 |
| 2022.09.17. 10:15 | 17 |
| 2022.09.17. 10:30 | 17 |
| 2022.09.17. 10:45 | 17 |
| 2022.09.17. 11:00 | 17 |
| 2022.09.17. 11:15 | 17 |
| 2022.09.17. 11:30 | 17 |
| 2022.09.17. 11:45 | 17 |
| 2022.09.17. 12:00 | 17 |
| 2022.09.17. 12:15 | 17 |
| 2022.09.17. 12:30 | 17 |
| 2022.09.17. 12:45 | 17 |
| 2022.09.17. 13:00 | 17 |
| 2022.09.17. 13:15 | 17 |
| 2022.09.17. 13:30 | 17 |
| 2022.09.17. 13:45 | 17 |
| 2022.09.17. 14:00 | 17 |
| 2022.09.17. 14:15 | 17 |
| 2022.09.17. 14:30 | 17 |
| 2022.09.17. 14:45 | 17 |
| 2022.09.17. 15:00 | 17 |
| 2022.09.17. 15:15 | 17 |
| 2022.09.17. 15:30 | 17 |
| 2022.09.17. 15:45 | 17 |
| 2022.09.17. 16:00 | 17 |
| 2022.09.17. 16:15 | 17 |
| 2022.09.17. 16:30 | 17 |
| 2022.09.17. 16:45 | 17 |
| 2022.09.17. 17:00 | 17 |
| 2022.09.17. 17:15 | 17 |
| 2022.09.17. 17:30 | 17 |
| 2022.09.17. 17:45 | 17 |
| 2022.09.17. 18:00 | 17 |
| 2022.09.17. 18:15 | 17 |
| 2022.09.17. 18:30 | 17 |
| 2022.09.17. 18:45 | 17 |
| 2022.09.17. 19:00 | 17 |
| 2022.09.17. 19:15 | 17 |
| 2022.09.17. 19:30 | 17 |
| 2022.09.17. 19:45 | 17 |
| 2022.09.17. 20:00 | 17 |
| 2022.09.17. 20:15 | 17 |
| 2022.09.17. 20:30 | 17 |
| 2022.09.17. 20:45 | 17 |
| 2022.09.17. 21:00 | 17 |
| 2022.09.17. 21:15 | 17 |
| 2022.09.17. 21:30 | 17 |
| 2022.09.17. 21:45 | 17 |
| 2022.09.17. 22:00 | 17 |
| 2022.09.17. 22:15 | 17 |
| 2022.09.17. 22:30 | 17 |
| 2022.09.17. 22:45 | 17 |
| 2022.09.17. 23:00 | 17 |
| 2022.09.17. 23:15 | 17 |
| 2022.09.17. 23:30 | 17 |
| 2022.09.17. 23:45 | 17 |
| 2022.09.18. 00:00 | 17 |
| 2022.09.18. 00:15 | 17 |
| 2022.09.18. 00:30 | 17 |
| 2022.09.18. 00:45 | 17 |
| 2022.09.18. 01:00 | 17 |
| 2022.09.18. 01:15 | 17 |
| 2022.09.18. 01:30 | 17 |
| 2022.09.18. 01:45 | 17 |
| 2022.09.18. 02:00 | 17 |
| 2022.09.18. 02:15 | 17 |
| 2022.09.18. 02:30 | 17 |
| 2022.09.18. 02:45 | 17 |
| 2022.09.18. 03:00 | 17 |
| 2022.09.18. 03:15 | 17 |
| 2022.09.18. 03:30 | 17 |
| 2022.09.18. 03:45 | 17 |
| 2022.09.18. 04:00 | 17 |
| 2022.09.18. 04:15 | 17 |
| 2022.09.18. 04:30 | 17 |
| 2022.09.18. 04:45 | 17 |
| 2022.09.18. 05:00 | 17 |
| 2022.09.18. 05:15 | 17 |
| 2022.09.18. 05:30 | 17 |
| 2022.09.18. 05:45 | 17 |
| 2022.09.18. 06:00 | 17 |
| 2022.09.18. 06:15 | 17 |
| 2022.09.18. 06:30 | 17 |
| 2022.09.18. 06:45 | 17 |
| 2022.09.18. 07:00 | 17 |
| 2022.09.18. 07:15 | 17 |
| 2022.09.18. 07:30 | 17 |
| 2022.09.18. 07:45 | 17 |
| 2022.09.18. 08:00 | 17 |
| 2022.09.18. 08:15 | 17 |
| 2022.09.18. 08:30 | 17 |
| 2022.09.18. 08:45 | 17 |
| 2022.09.18. 09:00 | 17 |
| 2022.09.18. 09:15 | 17 |
| 2022.09.18. 09:30 | 17 |
| 2022.09.18. 09:45 | 17 |
| 2022.09.18. 10:00 | 17 |
| 2022.09.18. 10:15 | 17 |
| 2022.09.18. 10:30 | 17 |
| 2022.09.18. 10:45 | 17 |
| 2022.09.18. 11:00 | 17 |
| 2022.09.18. 11:15 | 17 |
| 2022.09.18. 11:30 | 17 |
| 2022.09.18. 11:45 | 17 |
| 2022.09.18. 12:00 | 17 |
| 2022.09.18. 12:15 | 17 |
| 2022.09.18. 12:30 | 17 |
| 2022.09.18. 12:45 | 17 |
| 2022.09.18. 13:00 | 17 |
| 2022.09.18. 13:15 | 17 |
| 2022.09.18. 13:30 | 17 |
| 2022.09.18. 13:45 | 17 |
| 2022.09.18. 14:00 | 17 |
| 2022.09.18. 14:15 | 17 |
| 2022.09.18. 14:30 | 17 |
| 2022.09.18. 14:45 | 17 |
| 2022.09.18. 15:00 | 17 |
| 2022.09.18. 15:15 | 17 |
| 2022.09.18. 15:30 | 17 |
| 2022.09.18. 15:45 | 17 |
| 2022.09.18. 16:00 | 17 |
| 2022.09.18. 16:15 | 17 |
| 2022.09.18. 16:30 | 17 |
| 2022.09.18. 16:45 | 17 |
| 2022.09.18. 17:00 | 17 |
| 2022.09.18. 17:15 | 17 |
| 2022.09.18. 17:30 | 17 |
| 2022.09.18. 17:45 | 17 |
| 2022.09.18. 18:00 | 17 |
| 2022.09.18. 18:15 | 17 |
| 2022.09.18. 18:30 | 17 |
| 2022.09.18. 18:45 | 17 |
| 2022.09.18. 19:00 | 17 |
| 2022.09.18. 19:15 | 17 |
| 2022.09.18. 19:30 | 17 |
| 2022.09.18. 19:45 | 17 |
| 2022.09.18. 20:00 | 17 |
| 2022.09.18. 20:15 | 17 |
| 2022.09.18. 20:30 | 17 |
| 2022.09.18. 20:45 | 17 |
| 2022.09.18. 21:00 | 17 |
| 2022.09.18. 21:15 | 17 |
| 2022.09.18. 21:30 | 17 |
| 2022.09.18. 21:45 | 17 |
| 2022.09.18. 22:00 | 17 |
| 2022.09.18. 22:15 | 17 |
| 2022.09.18. 22:30 | 17 |
| 2022.09.18. 22:45 | 17 |
| 2022.09.18. 23:00 | 17 |
| 2022.09.18. 23:15 | 17 |
| 2022.09.18. 23:30 | 17 |
| 2022.09.18. 23:45 | 17 |
| 2022.09.19. 00:00 | 17 |
| 2022.09.19. 00:15 | 17 |
| 2022.09.19. 00:30 | 17 |
| 2022.09.19. 00:45 | 17 |
| 2022.09.19. 01:00 | 17 |
| 2022.09.19. 01:15 | 17 |
| 2022.09.19. 01:30 | 17 |
| 2022.09.19. 01:45 | 17 |
| 2022.09.19. 02:00 | 17 |
| 2022.09.19. 02:15 | 17 |
| 2022.09.19. 02:30 | 17 |
| 2022.09.19. 02:45 | 17 |
| 2022.09.19. 03:00 | 17 |
| 2022.09.19. 03:15 | 17 |
| 2022.09.19. 03:30 | 17 |
| 2022.09.19. 03:45 | 17 |
| 2022.09.19. 04:00 | 17 |
| 2022.09.19. 04:15 | 17 |
| 2022.09.19. 04:30 | 17 |
| 2022.09.19. 04:45 | 17 |
| 2022.09.19. 05:00 | 17 |
| 2022.09.19. 05:15 | 17 |
| 2022.09.19. 05:30 | 17 |
| 2022.09.19. 05:45 | 17 |
| 2022.09.19. 06:00 | 17 |
| 2022.09.19. 06:15 | 17 |
| 2022.09.19. 06:30 | 17 |
| 2022.09.19. 06:45 | 17 |
| 2022.09.19. 07:00 | 17 |
| 2022.09.19. 07:15 | 17 |
| 2022.09.19. 07:30 | 17 |
| 2022.09.19. 07:45 | 17 |
| 2022.09.19. 08:00 | 17 |
| 2022.09.19. 08:15 | 17 |
| 2022.09.19. 08:30 | 17 |
| 2022.09.19. 08:45 | 17 |
| 2022.09.19. 09:00 | 17 |
| 2022.09.19. 09:15 | 17 |
| 2022.09.19. 09:30 | 17 |
| 2022.09.19. 09:45 | 17 |
| 2022.09.19. 10:00 | 17 |
| 2022.09.19. 10:15 | 17 |
| 2022.09.19. 10:30 | 17 |
| 2022.09.19. 10:45 | 17 |
| 2022.09.19. 11:00 | 17 |
| 2022.09.19. 11:15 | 17 |
| 2022.09.19. 11:30 | 17 |
| 2022.09.19. 11:45 | 17 |
| 2022.09.19. 12:00 | 17 |
| 2022.09.19. 12:15 | 17 |
| 2022.09.19. 12:30 | 17 |
| 2022.09.19. 12:45 | 17 |
| 2022.09.19. 13:00 | 17 |
| 2022.09.19. 13:15 | 17 |
| 2022.09.19. 13:30 | 17 |
| 2022.09.19. 13:45 | 17 |
| 2022.09.19. 14:00 | 17 |
| 2022.09.19. 14:15 | 17 |
| 2022.09.19. 14:30 | 17 |
| 2022.09.19. 14:45 | 17 |
| 2022.09.19. 15:00 | 17 |
| 2022.09.19. 15:15 | 17 |
| 2022.09.19. 15:30 | 17 |
| 2022.09.19. 15:45 | 17 |
| 2022.09.19. 16:00 | 17 |
| 2022.09.19. 16:15 | 17 |
| 2022.09.19. 16:30 | 17 |
| 2022.09.19. 16:45 | 17 |
| 2022.09.19. 17:00 | 17 |
| 2022.09.19. 17:15 | 17 |
| 2022.09.19. 17:30 | 17 |
| 2022.09.19. 17:45 | 17 |
| 2022.09.19. 18:00 | 17 |
| 2022.09.19. 18:15 | 17 |
| 2022.09.19. 18:30 | 17 |
| 2022.09.19. 18:45 | 17 |
| 2022.09.19. 19:00 | 17 |
| 2022.09.19. 19:15 | 17 |
| 2022.09.19. 19:30 | 17 |
| 2022.09.19. 19:45 | 17 |
| 2022.09.19. 20:00 | 17 |
| 2022.09.19. 20:15 | 17 |
| 2022.09.19. 20:30 | 17 |
| 2022.09.19. 20:45 | 17 |
| 2022.09.19. 21:00 | 17 |
| 2022.09.19. 21:15 | 17 |
| 2022.09.19. 21:30 | 17 |
| 2022.09.19. 21:45 | 17 |
| 2022.09.19. 22:00 | 17 |
| 2022.09.19. 22:15 | 17 |
| 2022.09.19. 22:30 | 17 |
| 2022.09.19. 22:45 | 17 |
| 2022.09.19. 23:00 | 17 |
| 2022.09.19. 23:15 | 17 |
| 2022.09.19. 23:30 | 17 |
| 2022.09.19. 23:45 | 17 |
| 2022.09.20. 00:00 | 15 |
| 2022.09.20. 00:15 | 15 |
| 2022.09.20. 00:30 | 15 |
| 2022.09.20. 00:45 | 15 |
| 2022.09.20. 01:00 | 15 |
| 2022.09.20. 01:15 | 15 |
| 2022.09.20. 01:30 | 15 |
| 2022.09.20. 01:45 | 15 |
| 2022.09.20. 02:00 | 15 |
| 2022.09.20. 02:15 | 15 |
| 2022.09.20. 02:30 | 15 |
| 2022.09.20. 02:45 | 15 |
| 2022.09.20. 03:00 | 15 |
| 2022.09.20. 03:15 | 15 |
| 2022.09.20. 03:30 | 15 |
| 2022.09.20. 03:45 | 15 |
| 2022.09.20. 04:00 | 15 |
| 2022.09.20. 04:15 | 15 |
| 2022.09.20. 04:30 | 15 |
| 2022.09.20. 04:45 | 15 |
| 2022.09.20. 05:00 | 15 |
| 2022.09.20. 05:15 | 15 |
| 2022.09.20. 05:30 | 15 |
| 2022.09.20. 05:45 | 15 |
| 2022.09.20. 06:00 | 15 |
| 2022.09.20. 06:15 | 15 |
| 2022.09.20. 06:30 | 15 |
| 2022.09.20. 06:45 | 15 |
| 2022.09.20. 07:00 | 15 |
| 2022.09.20. 07:15 | 15 |
| 2022.09.20. 07:30 | 15 |
| 2022.09.20. 07:45 | 15 |
| 2022.09.20. 08:00 | 15 |
| 2022.09.20. 08:15 | 15 |
| 2022.09.20. 08:30 | 15 |
| 2022.09.20. 08:45 | 15 |
| 2022.09.20. 09:00 | 15 |
| 2022.09.20. 09:15 | 15 |
| 2022.09.20. 09:30 | 15 |
| 2022.09.20. 09:45 | 15 |
| 2022.09.20. 10:00 | 15 |
| 2022.09.20. 10:15 | 15 |
| 2022.09.20. 10:30 | 15 |
| 2022.09.20. 10:45 | 15 |
| 2022.09.20. 11:00 | 15 |
| 2022.09.20. 11:15 | 15 |
| 2022.09.20. 11:30 | 15 |
| 2022.09.20. 11:45 | 15 |
| 2022.09.20. 12:00 | 15 |
| 2022.09.20. 12:15 | 15 |
| 2022.09.20. 12:30 | 15 |
| 2022.09.20. 12:45 | 15 |
| 2022.09.20. 13:00 | 15 |
| 2022.09.20. 13:15 | 15 |
| 2022.09.20. 13:30 | 15 |
| 2022.09.20. 13:45 | 15 |
| 2022.09.20. 14:00 | 15 |
| 2022.09.20. 14:15 | 15 |
| 2022.09.20. 14:30 | 15 |
| 2022.09.20. 14:45 | 15 |
| 2022.09.20. 15:00 | 15 |
| 2022.09.20. 15:15 | 15 |
| 2022.09.20. 15:30 | 15 |
| 2022.09.20. 15:45 | 15 |
| 2022.09.20. 16:00 | 15 |
| 2022.09.20. 16:15 | 15 |
| 2022.09.20. 16:30 | 15 |
| 2022.09.20. 16:45 | 15 |
| 2022.09.20. 17:00 | 15 |
| 2022.09.20. 17:15 | 15 |
| 2022.09.20. 17:30 | 15 |
| 2022.09.20. 17:45 | 15 |
| 2022.09.20. 18:00 | 15 |
| 2022.09.20. 18:15 | 15 |
| 2022.09.20. 18:30 | 15 |
| 2022.09.20. 18:45 | 15 |
| 2022.09.20. 19:00 | 15 |
| 2022.09.20. 19:15 | 15 |
| 2022.09.20. 19:30 | 15 |
| 2022.09.20. 19:45 | 15 |
| 2022.09.20. 20:00 | 15 |
| 2022.09.20. 20:15 | 15 |
| 2022.09.20. 20:30 | 15 |
| 2022.09.20. 20:45 | 15 |
| 2022.09.20. 21:00 | 15 |
| 2022.09.20. 21:15 | 15 |
| 2022.09.20. 21:30 | 15 |
| 2022.09.20. 21:45 | 15 |
| 2022.09.20. 22:00 | 15 |
| 2022.09.20. 22:15 | 15 |
| 2022.09.20. 22:30 | 15 |
| 2022.09.20. 22:45 | 15 |
| 2022.09.20. 23:00 | 15 |
| 2022.09.20. 23:15 | 15 |
| 2022.09.20. 23:30 | 15 |
| 2022.09.20. 23:45 | 15 |
| 2022.09.21. 00:00 | 15 |
| 2022.09.21. 00:15 | 15 |
| 2022.09.21. 00:30 | 15 |
| 2022.09.21. 00:45 | 15 |
| 2022.09.21. 01:00 | 15 |
| 2022.09.21. 01:15 | 15 |
| 2022.09.21. 01:30 | 15 |
| 2022.09.21. 01:45 | 15 |
| 2022.09.21. 02:00 | 15 |
| 2022.09.21. 02:15 | 15 |
| 2022.09.21. 02:30 | 15 |
| 2022.09.21. 02:45 | 15 |
| 2022.09.21. 03:00 | 15 |
| 2022.09.21. 03:15 | 15 |
| 2022.09.21. 03:30 | 15 |
| 2022.09.21. 03:45 | 15 |
| 2022.09.21. 04:00 | 15 |
| 2022.09.21. 04:15 | 15 |
| 2022.09.21. 04:30 | 15 |
| 2022.09.21. 04:45 | 15 |
| 2022.09.21. 05:00 | 15 |
| 2022.09.21. 05:15 | 15 |
| 2022.09.21. 05:30 | 15 |
| 2022.09.21. 05:45 | 15 |
| 2022.09.21. 06:00 | 15 |
| 2022.09.21. 06:15 | 15 |
| 2022.09.21. 06:30 | 15 |
| 2022.09.21. 06:45 | 15 |
| 2022.09.21. 07:00 | 15 |
| 2022.09.21. 07:15 | 15 |
| 2022.09.21. 07:30 | 15 |
| 2022.09.21. 07:45 | 15 |
| 2022.09.21. 08:00 | 15 |
| 2022.09.21. 08:15 | 15 |
| 2022.09.21. 08:30 | 15 |
| 2022.09.21. 08:45 | 15 |
| 2022.09.21. 09:00 | 15 |
| 2022.09.21. 09:15 | 15 |
| 2022.09.21. 09:30 | 15 |
| 2022.09.21. 09:45 | 15 |
| 2022.09.21. 10:00 | 15 |
| 2022.09.21. 10:15 | 15 |
| 2022.09.21. 10:30 | 15 |
| 2022.09.21. 10:45 | 15 |
| 2022.09.21. 11:00 | 15 |
| 2022.09.21. 11:15 | 15 |
| 2022.09.21. 11:30 | 15 |
| 2022.09.21. 11:45 | 15 |
| 2022.09.21. 12:00 | 15 |
| 2022.09.21. 12:15 | 15 |
| 2022.09.21. 12:30 | 15 |
| 2022.09.21. 12:45 | 15 |
| 2022.09.21. 13:00 | 15 |
| 2022.09.21. 13:15 | 15 |
| 2022.09.21. 13:30 | 15 |
| 2022.09.21. 13:45 | 15 |
| 2022.09.21. 14:00 | 15 |
| 2022.09.21. 14:15 | 15 |
| 2022.09.21. 14:30 | 15 |
| 2022.09.21. 14:45 | 15 |
| 2022.09.21. 15:00 | 15 |
| 2022.09.21. 15:15 | 15 |
| 2022.09.21. 15:30 | 15 |
| 2022.09.21. 15:45 | 15 |
| 2022.09.21. 16:00 | 15 |
| 2022.09.21. 16:15 | 15 |
| 2022.09.21. 16:30 | 15 |
| 2022.09.21. 16:45 | 15 |
| 2022.09.21. 17:00 | 15 |
| 2022.09.21. 17:15 | 15 |
| 2022.09.21. 17:30 | 15 |
| 2022.09.21. 17:45 | 15 |
| 2022.09.21. 18:00 | 15 |
| 2022.09.21. 18:15 | 15 |
| 2022.09.21. 18:30 | 15 |
| 2022.09.21. 18:45 | 15 |
| 2022.09.21. 19:00 | 15 |
| 2022.09.21. 19:15 | 15 |
| 2022.09.21. 19:30 | 15 |
| 2022.09.21. 19:45 | 15 |
| 2022.09.21. 20:00 | 15 |
| 2022.09.21. 20:15 | 15 |
| 2022.09.21. 20:30 | 15 |
| 2022.09.21. 20:45 | 15 |
| 2022.09.21. 21:00 | 15 |
| 2022.09.21. 21:15 | 15 |
| 2022.09.21. 21:30 | 15 |
| 2022.09.21. 21:45 | 15 |
| 2022.09.21. 22:00 | 15 |
| 2022.09.21. 22:15 | 15 |
| 2022.09.21. 22:30 | 15 |
| 2022.09.21. 22:45 | 15 |
| 2022.09.21. 23:00 | 15 |
| 2022.09.21. 23:15 | 15 |
| 2022.09.21. 23:30 | 15 |
| 2022.09.21. 23:45 | 15 |
| 2022.09.22. 00:00 | 15 |
| 2022.09.22. 00:15 | 15 |
| 2022.09.22. 00:30 | 15 |
| 2022.09.22. 00:45 | 15 |
| 2022.09.22. 01:00 | 15 |
| 2022.09.22. 01:15 | 15 |
| 2022.09.22. 01:30 | 15 |
| 2022.09.22. 01:45 | 15 |
| 2022.09.22. 02:00 | 15 |
| 2022.09.22. 02:15 | 15 |
| 2022.09.22. 02:30 | 15 |
| 2022.09.22. 02:45 | 15 |
| 2022.09.22. 03:00 | 15 |
| 2022.09.22. 03:15 | 15 |
| 2022.09.22. 03:30 | 15 |
| 2022.09.22. 03:45 | 15 |
| 2022.09.22. 04:00 | 15 |
| 2022.09.22. 04:15 | 15 |
| 2022.09.22. 04:30 | 15 |
| 2022.09.22. 04:45 | 15 |
| 2022.09.22. 05:00 | 15 |
| 2022.09.22. 05:15 | 15 |
| 2022.09.22. 05:30 | 15 |
| 2022.09.22. 05:45 | 15 |
| 2022.09.22. 06:00 | 15 |
| 2022.09.22. 06:15 | 15 |
| 2022.09.22. 06:30 | 15 |
| 2022.09.22. 06:45 | 15 |
| 2022.09.22. 07:00 | 15 |
| 2022.09.22. 07:15 | 15 |
| 2022.09.22. 07:30 | 15 |
| 2022.09.22. 07:45 | 15 |
| 2022.09.22. 08:00 | 15 |
| 2022.09.22. 08:15 | 15 |
| 2022.09.22. 08:30 | 15 |
| 2022.09.22. 08:45 | 15 |
| 2022.09.22. 09:00 | 15 |
| 2022.09.22. 09:15 | 15 |
| 2022.09.22. 09:30 | 15 |
| 2022.09.22. 09:45 | 15 |
| 2022.09.22. 10:00 | 15 |
| 2022.09.22. 10:15 | 15 |
| 2022.09.22. 10:30 | 15 |
| 2022.09.22. 10:45 | 15 |
| 2022.09.22. 11:00 | 15 |
| 2022.09.22. 11:15 | 15 |
| 2022.09.22. 11:30 | 15 |
| 2022.09.22. 11:45 | 15 |
| 2022.09.22. 12:00 | 15 |
| 2022.09.22. 12:15 | 15 |
| 2022.09.22. 12:30 | 15 |
| 2022.09.22. 12:45 | 15 |
| 2022.09.22. 13:00 | 15 |
| 2022.09.22. 13:15 | 15 |
| 2022.09.22. 13:30 | 15 |
| 2022.09.22. 13:45 | 15 |
| 2022.09.22. 14:00 | 15 |
| 2022.09.22. 14:15 | 15 |
| 2022.09.22. 14:30 | 15 |
| 2022.09.22. 14:45 | 15 |
| 2022.09.22. 15:00 | 15 |
| 2022.09.22. 15:15 | 15 |
| 2022.09.22. 15:30 | 15 |
| 2022.09.22. 15:45 | 15 |
| 2022.09.22. 16:00 | 15 |
| 2022.09.22. 16:15 | 15 |
| 2022.09.22. 16:30 | 15 |
| 2022.09.22. 16:45 | 15 |
| 2022.09.22. 17:00 | 15 |
| 2022.09.22. 17:15 | 15 |
| 2022.09.22. 17:30 | 15 |
| 2022.09.22. 17:45 | 15 |
| 2022.09.22. 18:00 | 15 |
| 2022.09.22. 18:15 | 15 |
| 2022.09.22. 18:30 | 15 |
| 2022.09.22. 18:45 | 15 |
| 2022.09.22. 19:00 | 15 |
| 2022.09.22. 19:15 | 15 |
| 2022.09.22. 19:30 | 15 |
| 2022.09.22. 19:45 | 15 |
| 2022.09.22. 20:00 | 15 |
| 2022.09.22. 20:15 | 15 |
| 2022.09.22. 20:30 | 15 |
| 2022.09.22. 20:45 | 15 |
| 2022.09.22. 21:00 | 15 |
| 2022.09.22. 21:15 | 15 |
| 2022.09.22. 21:30 | 15 |
| 2022.09.22. 21:45 | 15 |
| 2022.09.22. 22:00 | 15 |
| 2022.09.22. 22:15 | 15 |
| 2022.09.22. 22:30 | 15 |
| 2022.09.22. 22:45 | 15 |
| 2022.09.22. 23:00 | 15 |
| 2022.09.22. 23:15 | 15 |
| 2022.09.22. 23:30 | 15 |
| 2022.09.22. 23:45 | 15 |
| 2022.09.23. 00:00 | 15 |
| 2022.09.23. 00:15 | 15 |
| 2022.09.23. 00:30 | 15 |
| 2022.09.23. 00:45 | 15 |
| 2022.09.23. 01:00 | 15 |
| 2022.09.23. 01:15 | 15 |
| 2022.09.23. 01:30 | 15 |
| 2022.09.23. 01:45 | 15 |
| 2022.09.23. 02:00 | 15 |
| 2022.09.23. 02:15 | 15 |
| 2022.09.23. 02:30 | 15 |
| 2022.09.23. 02:45 | 15 |
| 2022.09.23. 03:00 | 15 |
| 2022.09.23. 03:15 | 15 |
| 2022.09.23. 03:30 | 15 |
| 2022.09.23. 03:45 | 15 |
| 2022.09.23. 04:00 | 15 |
| 2022.09.23. 04:15 | 15 |
| 2022.09.23. 04:30 | 15 |
| 2022.09.23. 04:45 | 15 |
| 2022.09.23. 05:00 | 15 |
| 2022.09.23. 05:15 | 15 |
| 2022.09.23. 05:30 | 15 |
| 2022.09.23. 05:45 | 15 |
| 2022.09.23. 06:00 | 15 |
| 2022.09.23. 06:15 | 15 |
| 2022.09.23. 06:30 | 15 |
| 2022.09.23. 06:45 | 15 |
| 2022.09.23. 07:00 | 15 |
| 2022.09.23. 07:15 | 15 |
| 2022.09.23. 07:30 | 15 |
| 2022.09.23. 07:45 | 15 |
| 2022.09.23. 08:00 | 15 |
| 2022.09.23. 08:15 | 15 |
| 2022.09.23. 08:30 | 15 |
| 2022.09.23. 08:45 | 15 |
| 2022.09.23. 09:00 | 15 |
| 2022.09.23. 09:15 | 15 |
| 2022.09.23. 09:30 | 15 |
| 2022.09.23. 09:45 | 15 |
| 2022.09.23. 10:00 | 15 |
| 2022.09.23. 10:15 | 15 |
| 2022.09.23. 10:30 | 15 |
| 2022.09.23. 10:45 | 15 |
| 2022.09.23. 11:00 | 15 |
| 2022.09.23. 11:15 | 15 |
| 2022.09.23. 11:30 | 15 |
| 2022.09.23. 11:45 | 15 |
| 2022.09.23. 12:00 | 15 |
| 2022.09.23. 12:15 | 15 |
| 2022.09.23. 12:30 | 15 |
| 2022.09.23. 12:45 | 15 |
| 2022.09.23. 13:00 | 15 |
| 2022.09.23. 13:15 | 15 |
| 2022.09.23. 13:30 | 15 |
| 2022.09.23. 13:45 | 15 |
| 2022.09.23. 14:00 | 15 |
| 2022.09.23. 14:15 | 15 |
| 2022.09.23. 14:30 | 15 |
| 2022.09.23. 14:45 | 15 |
| 2022.09.23. 15:00 | 15 |
| 2022.09.23. 15:15 | 15 |
| 2022.09.23. 15:30 | 15 |
| 2022.09.23. 15:45 | 15 |
| 2022.09.23. 16:00 | 15 |
| 2022.09.23. 16:15 | 15 |
| 2022.09.23. 16:30 | 15 |
| 2022.09.23. 16:45 | 15 |
| 2022.09.23. 17:00 | 15 |
| 2022.09.23. 17:15 | 15 |
| 2022.09.23. 17:30 | 15 |
| 2022.09.23. 17:45 | 15 |
| 2022.09.23. 18:00 | 15 |
| 2022.09.23. 18:15 | 15 |
| 2022.09.23. 18:30 | 15 |
| 2022.09.23. 18:45 | 15 |
| 2022.09.23. 19:00 | 15 |
| 2022.09.23. 19:15 | 15 |
| 2022.09.23. 19:30 | 15 |
| 2022.09.23. 19:45 | 15 |
| 2022.09.23. 20:00 | 15 |
| 2022.09.23. 20:15 | 15 |
| 2022.09.23. 20:30 | 15 |
| 2022.09.23. 20:45 | 15 |
| 2022.09.23. 21:00 | 15 |
| 2022.09.23. 21:15 | 15 |
| 2022.09.23. 21:30 | 15 |
| 2022.09.23. 21:45 | 15 |
| 2022.09.23. 22:00 | 15 |
| 2022.09.23. 22:15 | 15 |
| 2022.09.23. 22:30 | 15 |
| 2022.09.23. 22:45 | 15 |
| 2022.09.23. 23:00 | 15 |
| 2022.09.23. 23:15 | 15 |
| 2022.09.23. 23:30 | 15 |
| 2022.09.23. 23:45 | 15 |
| 2022.09.24. 00:00 | 15 |
| 2022.09.24. 00:15 | 15 |
| 2022.09.24. 00:30 | 15 |
| 2022.09.24. 00:45 | 15 |
| 2022.09.24. 01:00 | 15 |
| 2022.09.24. 01:15 | 15 |
| 2022.09.24. 01:30 | 15 |
| 2022.09.24. 01:45 | 15 |
| 2022.09.24. 02:00 | 15 |
| 2022.09.24. 02:15 | 15 |
| 2022.09.24. 02:30 | 15 |
| 2022.09.24. 02:45 | 15 |
| 2022.09.24. 03:00 | 15 |
| 2022.09.24. 03:15 | 15 |
| 2022.09.24. 03:30 | 15 |
| 2022.09.24. 03:45 | 15 |
| 2022.09.24. 04:00 | 15 |
| 2022.09.24. 04:15 | 15 |
| 2022.09.24. 04:30 | 15 |
| 2022.09.24. 04:45 | 15 |
| 2022.09.24. 05:00 | 15 |
| 2022.09.24. 05:15 | 15 |
| 2022.09.24. 05:30 | 15 |
| 2022.09.24. 05:45 | 15 |
| 2022.09.24. 06:00 | 15 |
| 2022.09.24. 06:15 | 15 |
| 2022.09.24. 06:30 | 15 |
| 2022.09.24. 06:45 | 15 |
| 2022.09.24. 07:00 | 15 |
| 2022.09.24. 07:15 | 15 |
| 2022.09.24. 07:30 | 15 |
| 2022.09.24. 07:45 | 15 |
| 2022.09.24. 08:00 | 15 |
| 2022.09.24. 08:15 | 15 |
| 2022.09.24. 08:30 | 15 |
| 2022.09.24. 08:45 | 15 |
| 2022.09.24. 09:00 | 15 |
| 2022.09.24. 09:15 | 15 |
| 2022.09.24. 09:30 | 15 |
| 2022.09.24. 09:45 | 15 |
| 2022.09.24. 10:00 | 15 |
| 2022.09.24. 10:15 | 15 |
| 2022.09.24. 10:30 | 15 |
| 2022.09.24. 10:45 | 15 |
| 2022.09.24. 11:00 | 15 |
| 2022.09.24. 11:15 | 15 |
| 2022.09.24. 11:30 | 15 |
| 2022.09.24. 11:45 | 15 |
| 2022.09.24. 12:00 | 15 |
| 2022.09.24. 12:15 | 15 |
| 2022.09.24. 12:30 | 15 |
| 2022.09.24. 12:45 | 15 |
| 2022.09.24. 13:00 | 15 |
| 2022.09.24. 13:15 | 15 |
| 2022.09.24. 13:30 | 15 |
| 2022.09.24. 13:45 | 15 |
| 2022.09.24. 14:00 | 15 |
| 2022.09.24. 14:15 | 15 |
| 2022.09.24. 14:30 | 15 |
| 2022.09.24. 14:45 | 15 |
| 2022.09.24. 15:00 | 15 |
| 2022.09.24. 15:15 | 15 |
| 2022.09.24. 15:30 | 15 |
| 2022.09.24. 15:45 | 15 |
| 2022.09.24. 16:00 | 15 |
| 2022.09.24. 16:15 | 15 |
| 2022.09.24. 16:30 | 15 |
| 2022.09.24. 16:45 | 15 |
| 2022.09.24. 17:00 | 15 |
| 2022.09.24. 17:15 | 15 |
| 2022.09.24. 17:30 | 15 |
| 2022.09.24. 17:45 | 15 |
| 2022.09.24. 18:00 | 15 |
| 2022.09.24. 18:15 | 15 |
| 2022.09.24. 18:30 | 15 |
| 2022.09.24. 18:45 | 15 |
| 2022.09.24. 19:00 | 15 |
| 2022.09.24. 19:15 | 15 |
| 2022.09.24. 19:30 | 15 |
| 2022.09.24. 19:45 | 15 |
| 2022.09.24. 20:00 | 15 |
| 2022.09.24. 20:15 | 15 |
| 2022.09.24. 20:30 | 15 |
| 2022.09.24. 20:45 | 15 |
| 2022.09.24. 21:00 | 15 |
| 2022.09.24. 21:15 | 15 |
| 2022.09.24. 21:30 | 15 |
| 2022.09.24. 21:45 | 15 |
| 2022.09.24. 22:00 | 15 |
| 2022.09.24. 22:15 | 15 |
| 2022.09.24. 22:30 | 15 |
| 2022.09.24. 22:45 | 15 |
| 2022.09.24. 23:00 | 15 |
| 2022.09.24. 23:15 | 15 |
| 2022.09.24. 23:30 | 15 |
| 2022.09.24. 23:45 | 15 |
| 2022.09.25. 00:00 | 15 |
| 2022.09.25. 00:15 | 15 |
| 2022.09.25. 00:30 | 15 |
| 2022.09.25. 00:45 | 15 |
| 2022.09.25. 01:00 | 15 |
| 2022.09.25. 01:15 | 15 |
| 2022.09.25. 01:30 | 15 |
| 2022.09.25. 01:45 | 15 |
| 2022.09.25. 02:00 | 15 |
| 2022.09.25. 02:15 | 15 |
| 2022.09.25. 02:30 | 15 |
| 2022.09.25. 02:45 | 15 |
| 2022.09.25. 03:00 | 15 |
| 2022.09.25. 03:15 | 15 |
| 2022.09.25. 03:30 | 15 |
| 2022.09.25. 03:45 | 15 |
| 2022.09.25. 04:00 | 15 |
| 2022.09.25. 04:15 | 15 |
| 2022.09.25. 04:30 | 15 |
| 2022.09.25. 04:45 | 15 |
| 2022.09.25. 05:00 | 15 |
| 2022.09.25. 05:15 | 15 |
| 2022.09.25. 05:30 | 15 |
| 2022.09.25. 05:45 | 15 |
| 2022.09.25. 06:00 | 15 |
| 2022.09.25. 06:15 | 15 |
| 2022.09.25. 06:30 | 15 |
| 2022.09.25. 06:45 | 15 |
| 2022.09.25. 07:00 | 15 |
| 2022.09.25. 07:15 | 15 |
| 2022.09.25. 07:30 | 15 |
| 2022.09.25. 07:45 | 15 |
| 2022.09.25. 08:00 | 15 |
| 2022.09.25. 08:15 | 15 |
| 2022.09.25. 08:30 | 15 |
| 2022.09.25. 08:45 | 15 |
| 2022.09.25. 09:00 | 15 |
| 2022.09.25. 09:15 | 15 |
| 2022.09.25. 09:30 | 15 |
| 2022.09.25. 09:45 | 15 |
| 2022.09.25. 10:00 | 15 |
| 2022.09.25. 10:15 | 15 |
| 2022.09.25. 10:30 | 15 |
| 2022.09.25. 10:45 | 15 |
| 2022.09.25. 11:00 | 15 |
| 2022.09.25. 11:15 | 15 |
| 2022.09.25. 11:30 | 15 |
| 2022.09.25. 11:45 | 15 |
| 2022.09.25. 12:00 | 15 |
| 2022.09.25. 12:15 | 15 |
| 2022.09.25. 12:30 | 15 |
| 2022.09.25. 12:45 | 15 |
| 2022.09.25. 13:00 | 15 |
| 2022.09.25. 13:15 | 15 |
| 2022.09.25. 13:30 | 15 |
| 2022.09.25. 13:45 | 15 |
| 2022.09.25. 14:00 | 15 |
| 2022.09.25. 14:15 | 15 |
| 2022.09.25. 14:30 | 15 |
| 2022.09.25. 14:45 | 15 |
| 2022.09.25. 15:00 | 15 |
| 2022.09.25. 15:15 | 15 |
| 2022.09.25. 15:30 | 15 |
| 2022.09.25. 15:45 | 15 |
| 2022.09.25. 16:00 | 15 |
| 2022.09.25. 16:15 | 15 |
| 2022.09.25. 16:30 | 15 |
| 2022.09.25. 16:45 | 15 |
| 2022.09.25. 17:00 | 15 |
| 2022.09.25. 17:15 | 15 |
| 2022.09.25. 17:30 | 15 |
| 2022.09.25. 17:45 | 15 |
| 2022.09.25. 18:00 | 15 |
| 2022.09.25. 18:15 | 15 |
| 2022.09.25. 18:30 | 15 |
| 2022.09.25. 18:45 | 15 |
| 2022.09.25. 19:00 | 15 |
| 2022.09.25. 19:15 | 15 |
| 2022.09.25. 19:30 | 15 |
| 2022.09.25. 19:45 | 15 |
| 2022.09.25. 20:00 | 15 |
| 2022.09.25. 20:15 | 15 |
| 2022.09.25. 20:30 | 15 |
| 2022.09.25. 20:45 | 15 |
| 2022.09.25. 21:00 | 15 |
| 2022.09.25. 21:15 | 15 |
| 2022.09.25. 21:30 | 15 |
| 2022.09.25. 21:45 | 15 |
| 2022.09.25. 22:00 | 15 |
| 2022.09.25. 22:15 | 15 |
| 2022.09.25. 22:30 | 15 |
| 2022.09.25. 22:45 | 15 |
| 2022.09.25. 23:00 | 15 |
| 2022.09.25. 23:15 | 15 |
| 2022.09.25. 23:30 | 15 |
| 2022.09.25. 23:45 | 15 |
| 2022.09.26. 00:00 | 15 |
| 2022.09.26. 00:15 | 15 |
| 2022.09.26. 00:30 | 15 |
| 2022.09.26. 00:45 | 15 |
| 2022.09.26. 01:00 | 15 |
| 2022.09.26. 01:15 | 15 |
| 2022.09.26. 01:30 | 15 |
| 2022.09.26. 01:45 | 15 |
| 2022.09.26. 02:00 | 15 |
| 2022.09.26. 02:15 | 15 |
| 2022.09.26. 02:30 | 15 |
| 2022.09.26. 02:45 | 15 |
| 2022.09.26. 03:00 | 15 |
| 2022.09.26. 03:15 | 15 |
| 2022.09.26. 03:30 | 15 |
| 2022.09.26. 03:45 | 15 |
| 2022.09.26. 04:00 | 15 |
| 2022.09.26. 04:15 | 15 |
| 2022.09.26. 04:30 | 15 |
| 2022.09.26. 04:45 | 15 |
| 2022.09.26. 05:00 | 15 |
| 2022.09.26. 05:15 | 15 |
| 2022.09.26. 05:30 | 15 |
| 2022.09.26. 05:45 | 15 |
| 2022.09.26. 06:00 | 15 |
| 2022.09.26. 06:15 | 15 |
| 2022.09.26. 06:30 | 15 |
| 2022.09.26. 06:45 | 15 |
| 2022.09.26. 07:00 | 15 |
| 2022.09.26. 07:15 | 15 |
| 2022.09.26. 07:30 | 15 |
| 2022.09.26. 07:45 | 15 |
| 2022.09.26. 08:00 | 15 |
| 2022.09.26. 08:15 | 15 |
| 2022.09.26. 08:30 | 15 |
| 2022.09.26. 08:45 | 15 |
| 2022.09.26. 09:00 | 15 |
| 2022.09.26. 09:15 | 15 |
| 2022.09.26. 09:30 | 15 |
| 2022.09.26. 09:45 | 15 |
| 2022.09.26. 10:00 | 15 |
| 2022.09.26. 10:15 | 15 |
| 2022.09.26. 10:30 | 15 |
| 2022.09.26. 10:45 | 15 |
| 2022.09.26. 11:00 | 15 |
| 2022.09.26. 11:15 | 15 |
| 2022.09.26. 11:30 | 15 |
| 2022.09.26. 11:45 | 15 |
| 2022.09.26. 12:00 | 15 |
| 2022.09.26. 12:15 | 15 |
| 2022.09.26. 12:30 | 15 |
| 2022.09.26. 12:45 | 15 |
| 2022.09.26. 13:00 | 15 |
| 2022.09.26. 13:15 | 15 |
| 2022.09.26. 13:30 | 15 |
| 2022.09.26. 13:45 | 15 |
| 2022.09.26. 14:00 | 15 |
| 2022.09.26. 14:15 | 15 |
| 2022.09.26. 14:30 | 15 |
| 2022.09.26. 14:45 | 15 |
| 2022.09.26. 15:00 | 15 |
| 2022.09.26. 15:15 | 15 |
| 2022.09.26. 15:30 | 15 |
| 2022.09.26. 15:45 | 15 |
| 2022.09.26. 16:00 | 15 |
| 2022.09.26. 16:15 | 15 |
| 2022.09.26. 16:30 | 15 |
| 2022.09.26. 16:45 | 15 |
| 2022.09.26. 17:00 | 15 |
| 2022.09.26. 17:15 | 15 |
| 2022.09.26. 17:30 | 15 |
| 2022.09.26. 17:45 | 15 |
| 2022.09.26. 18:00 | 15 |
| 2022.09.26. 18:15 | 15 |
| 2022.09.26. 18:30 | 15 |
| 2022.09.26. 18:45 | 15 |
| 2022.09.26. 19:00 | 15 |
| 2022.09.26. 19:15 | 15 |
| 2022.09.26. 19:30 | 15 |
| 2022.09.26. 19:45 | 15 |
| 2022.09.26. 20:00 | 15 |
| 2022.09.26. 20:15 | 15 |
| 2022.09.26. 20:30 | 15 |
| 2022.09.26. 20:45 | 15 |
| 2022.09.26. 21:00 | 15 |
| 2022.09.26. 21:15 | 15 |
| 2022.09.26. 21:30 | 15 |
| 2022.09.26. 21:45 | 15 |
| 2022.09.26. 22:00 | 15 |
| 2022.09.26. 22:15 | 15 |
| 2022.09.26. 22:30 | 15 |
| 2022.09.26. 22:45 | 15 |
| 2022.09.26. 23:00 | 15 |
| 2022.09.26. 23:15 | 15 |
| 2022.09.26. 23:30 | 15 |
| 2022.09.26. 23:45 | 15 |
| 2022.09.27. 00:00 | 15 |
| 2022.09.27. 00:15 | 15 |
| 2022.09.27. 00:30 | 15 |
| 2022.09.27. 00:45 | 15 |
| 2022.09.27. 01:00 | 15 |
| 2022.09.27. 01:15 | 15 |
| 2022.09.27. 01:30 | 15 |
| 2022.09.27. 01:45 | 15 |
| 2022.09.27. 02:00 | 15 |
| 2022.09.27. 02:15 | 15 |
| 2022.09.27. 02:30 | 15 |
| 2022.09.27. 02:45 | 15 |
| 2022.09.27. 03:00 | 15 |
| 2022.09.27. 03:15 | 15 |
| 2022.09.27. 03:30 | 15 |
| 2022.09.27. 03:45 | 15 |
| 2022.09.27. 04:00 | 15 |
| 2022.09.27. 04:15 | 15 |
| 2022.09.27. 04:30 | 15 |
| 2022.09.27. 04:45 | 15 |
| 2022.09.27. 05:00 | 15 |
| 2022.09.27. 05:15 | 15 |
| 2022.09.27. 05:30 | 15 |
| 2022.09.27. 05:45 | 15 |
| 2022.09.27. 06:00 | 15 |
| 2022.09.27. 06:15 | 15 |
| 2022.09.27. 06:30 | 15 |
| 2022.09.27. 06:45 | 15 |
| 2022.09.27. 07:00 | 15 |
| 2022.09.27. 07:15 | 15 |
| 2022.09.27. 07:30 | 15 |
| 2022.09.27. 07:45 | 15 |
| 2022.09.27. 08:00 | 15 |
| 2022.09.27. 08:15 | 15 |
| 2022.09.27. 08:30 | 15 |
| 2022.09.27. 08:45 | 15 |
| 2022.09.27. 09:00 | 15 |
| 2022.09.27. 09:15 | 15 |
| 2022.09.27. 09:30 | 15 |
| 2022.09.27. 09:45 | 15 |
| 2022.09.27. 10:00 | 15 |
| 2022.09.27. 10:15 | 15 |
| 2022.09.27. 10:30 | 15 |
| 2022.09.27. 10:45 | 15 |
| 2022.09.27. 11:00 | 15 |
| 2022.09.27. 11:15 | 15 |
| 2022.09.27. 11:30 | 15 |
| 2022.09.27. 11:45 | 15 |
| 2022.09.27. 12:00 | 15 |
| 2022.09.27. 12:15 | 15 |
| 2022.09.27. 12:30 | 15 |
| 2022.09.27. 12:45 | 15 |
| 2022.09.27. 13:00 | 15 |
| 2022.09.27. 13:15 | 15 |
| 2022.09.27. 13:30 | 15 |
| 2022.09.27. 13:45 | 15 |
| 2022.09.27. 14:00 | 15 |
| 2022.09.27. 14:15 | 15 |
| 2022.09.27. 14:30 | 15 |
| 2022.09.27. 14:45 | 15 |
| 2022.09.27. 15:00 | 15 |
| 2022.09.27. 15:15 | 15 |
| 2022.09.27. 15:30 | 15 |
| 2022.09.27. 15:45 | 15 |
| 2022.09.27. 16:00 | 15 |
| 2022.09.27. 16:15 | 15 |
| 2022.09.27. 16:30 | 15 |
| 2022.09.27. 16:45 | 15 |
| 2022.09.27. 17:00 | 15 |
| 2022.09.27. 17:15 | 15 |
| 2022.09.27. 17:30 | 15 |
| 2022.09.27. 17:45 | 15 |
| 2022.09.27. 18:00 | 15 |
| 2022.09.27. 18:15 | 15 |
| 2022.09.27. 18:30 | 15 |
| 2022.09.27. 18:45 | 15 |
| 2022.09.27. 19:00 | 15 |
| 2022.09.27. 19:15 | 15 |
| 2022.09.27. 19:30 | 15 |
| 2022.09.27. 19:45 | 15 |
| 2022.09.27. 20:00 | 15 |
| 2022.09.27. 20:15 | 15 |
| 2022.09.27. 20:30 | 15 |
| 2022.09.27. 20:45 | 15 |
| 2022.09.27. 21:00 | 15 |
| 2022.09.27. 21:15 | 15 |
| 2022.09.27. 21:30 | 15 |
| 2022.09.27. 21:45 | 15 |
| 2022.09.27. 22:00 | 15 |
| 2022.09.27. 22:15 | 15 |
| 2022.09.27. 22:30 | 15 |
| 2022.09.27. 22:45 | 15 |
| 2022.09.27. 23:00 | 15 |
| 2022.09.27. 23:15 | 15 |
| 2022.09.27. 23:30 | 15 |
| 2022.09.27. 23:45 | 15 |
| 2022.09.28. 00:00 | 15 |
| 2022.09.28. 00:15 | 15 |
| 2022.09.28. 00:30 | 15 |
| 2022.09.28. 00:45 | 15 |
| 2022.09.28. 01:00 | 15 |
| 2022.09.28. 01:15 | 15 |
| 2022.09.28. 01:30 | 15 |
| 2022.09.28. 01:45 | 15 |
| 2022.09.28. 02:00 | 15 |
| 2022.09.28. 02:15 | 15 |
| 2022.09.28. 02:30 | 15 |
| 2022.09.28. 02:45 | 15 |
| 2022.09.28. 03:00 | 15 |
| 2022.09.28. 03:15 | 15 |
| 2022.09.28. 03:30 | 15 |
| 2022.09.28. 03:45 | 15 |
| 2022.09.28. 04:00 | 15 |
| 2022.09.28. 04:15 | 15 |
| 2022.09.28. 04:30 | 15 |
| 2022.09.28. 04:45 | 15 |
| 2022.09.28. 05:00 | 15 |
| 2022.09.28. 05:15 | 15 |
| 2022.09.28. 05:30 | 15 |
| 2022.09.28. 05:45 | 15 |
| 2022.09.28. 06:00 | 15 |
| 2022.09.28. 06:15 | 15 |
| 2022.09.28. 06:30 | 15 |
| 2022.09.28. 06:45 | 15 |
| 2022.09.28. 07:00 | 15 |
| 2022.09.28. 07:15 | 15 |
| 2022.09.28. 07:30 | 15 |
| 2022.09.28. 07:45 | 15 |
| 2022.09.28. 08:00 | 15 |
| 2022.09.28. 08:15 | 15 |
| 2022.09.28. 08:30 | 15 |
| 2022.09.28. 08:45 | 15 |
| 2022.09.28. 09:00 | 15 |
| 2022.09.28. 09:15 | 15 |
| 2022.09.28. 09:30 | 15 |
| 2022.09.28. 09:45 | 15 |
| 2022.09.28. 10:00 | 15 |
| 2022.09.28. 10:15 | 15 |
| 2022.09.28. 10:30 | 15 |
| 2022.09.28. 10:45 | 15 |
| 2022.09.28. 11:00 | 15 |
| 2022.09.28. 11:15 | 15 |
| 2022.09.28. 11:30 | 15 |
| 2022.09.28. 11:45 | 15 |
| 2022.09.28. 12:00 | 15 |
| 2022.09.28. 12:15 | 15 |
| 2022.09.28. 12:30 | 15 |
| 2022.09.28. 12:45 | 15 |
| 2022.09.28. 13:00 | 15 |
| 2022.09.28. 13:15 | 15 |
| 2022.09.28. 13:30 | 15 |
| 2022.09.28. 13:45 | 15 |
| 2022.09.28. 14:00 | 15 |
| 2022.09.28. 14:15 | 15 |
| 2022.09.28. 14:30 | 15 |
| 2022.09.28. 14:45 | 15 |
| 2022.09.28. 15:00 | 15 |
| 2022.09.28. 15:15 | 15 |
| 2022.09.28. 15:30 | 15 |
| 2022.09.28. 15:45 | 15 |
| 2022.09.28. 16:00 | 15 |
| 2022.09.28. 16:15 | 15 |
| 2022.09.28. 16:30 | 15 |
| 2022.09.28. 16:45 | 15 |
| 2022.09.28. 17:00 | 15 |
| 2022.09.28. 17:15 | 15 |
| 2022.09.28. 17:30 | 15 |
| 2022.09.28. 17:45 | 15 |
| 2022.09.28. 18:00 | 15 |
| 2022.09.28. 18:15 | 15 |
| 2022.09.28. 18:30 | 15 |
| 2022.09.28. 18:45 | 15 |
| 2022.09.28. 19:00 | 15 |
| 2022.09.28. 19:15 | 15 |
| 2022.09.28. 19:30 | 15 |
| 2022.09.28. 19:45 | 15 |
| 2022.09.28. 20:00 | 15 |
| 2022.09.28. 20:15 | 15 |
| 2022.09.28. 20:30 | 15 |
| 2022.09.28. 20:45 | 15 |
| 2022.09.28. 21:00 | 15 |
| 2022.09.28. 21:15 | 15 |
| 2022.09.28. 21:30 | 15 |
| 2022.09.28. 21:45 | 15 |
| 2022.09.28. 22:00 | 15 |
| 2022.09.28. 22:15 | 15 |
| 2022.09.28. 22:30 | 15 |
| 2022.09.28. 22:45 | 15 |
| 2022.09.28. 23:00 | 15 |
| 2022.09.28. 23:15 | 15 |
| 2022.09.28. 23:30 | 15 |
| 2022.09.28. 23:45 | 15 |
| 2022.09.29. 00:00 | 15 |
| 2022.09.29. 00:15 | 15 |
| 2022.09.29. 00:30 | 15 |
| 2022.09.29. 00:45 | 15 |
| 2022.09.29. 01:00 | 15 |
| 2022.09.29. 01:15 | 15 |
| 2022.09.29. 01:30 | 15 |
| 2022.09.29. 01:45 | 15 |
| 2022.09.29. 02:00 | 15 |
| 2022.09.29. 02:15 | 15 |
| 2022.09.29. 02:30 | 15 |
| 2022.09.29. 02:45 | 15 |
| 2022.09.29. 03:00 | 15 |
| 2022.09.29. 03:15 | 15 |
| 2022.09.29. 03:30 | 15 |
| 2022.09.29. 03:45 | 15 |
| 2022.09.29. 04:00 | 15 |
| 2022.09.29. 04:15 | 15 |
| 2022.09.29. 04:30 | 15 |
| 2022.09.29. 04:45 | 15 |
| 2022.09.29. 05:00 | 15 |
| 2022.09.29. 05:15 | 15 |
| 2022.09.29. 05:30 | 15 |
| 2022.09.29. 05:45 | 15 |
| 2022.09.29. 06:00 | 15 |
| 2022.09.29. 06:15 | 15 |
| 2022.09.29. 06:30 | 15 |
| 2022.09.29. 06:45 | 15 |
| 2022.09.29. 07:00 | 15 |
| 2022.09.29. 07:15 | 15 |
| 2022.09.29. 07:30 | 15 |
| 2022.09.29. 07:45 | 15 |
| 2022.09.29. 08:00 | 15 |
| 2022.09.29. 08:15 | 15 |
| 2022.09.29. 08:30 | 15 |
| 2022.09.29. 08:45 | 15 |
| 2022.09.29. 09:00 | 15 |
| 2022.09.29. 09:15 | 15 |
| 2022.09.29. 09:30 | 15 |
| 2022.09.29. 09:45 | 15 |
| 2022.09.29. 10:00 | 15 |
| 2022.09.29. 10:15 | 15 |
| 2022.09.29. 10:30 | 15 |
| 2022.09.29. 10:45 | 15 |
| 2022.09.29. 11:00 | 15 |
| 2022.09.29. 11:15 | 15 |
| 2022.09.29. 11:30 | 15 |
| 2022.09.29. 11:45 | 15 |
| 2022.09.29. 12:00 | 15 |
| 2022.09.29. 12:15 | 15 |
| 2022.09.29. 12:30 | 15 |
| 2022.09.29. 12:45 | 15 |
| 2022.09.29. 13:00 | 15 |
| 2022.09.29. 13:15 | 15 |
| 2022.09.29. 13:30 | 15 |
| 2022.09.29. 13:45 | 15 |
| 2022.09.29. 14:00 | 15 |
| 2022.09.29. 14:15 | 15 |
| 2022.09.29. 14:30 | 15 |
| 2022.09.29. 14:45 | 15 |
| 2022.09.29. 15:00 | 15 |
| 2022.09.29. 15:15 | 15 |
| 2022.09.29. 15:30 | 15 |
| 2022.09.29. 15:45 | 15 |
| 2022.09.29. 16:00 | 15 |
| 2022.09.29. 16:15 | 15 |
| 2022.09.29. 16:30 | 15 |
| 2022.09.29. 16:45 | 15 |
| 2022.09.29. 17:00 | 15 |
| 2022.09.29. 17:15 | 15 |
| 2022.09.29. 17:30 | 15 |
| 2022.09.29. 17:45 | 15 |
| 2022.09.29. 18:00 | 15 |
| 2022.09.29. 18:15 | 15 |
| 2022.09.29. 18:30 | 15 |
| 2022.09.29. 18:45 | 15 |
| 2022.09.29. 19:00 | 15 |
| 2022.09.29. 19:15 | 15 |
| 2022.09.29. 19:30 | 15 |
| 2022.09.29. 19:45 | 15 |
| 2022.09.29. 20:00 | 15 |
| 2022.09.29. 20:15 | 15 |
| 2022.09.29. 20:30 | 15 |
| 2022.09.29. 20:45 | 15 |
| 2022.09.29. 21:00 | 15 |
| 2022.09.29. 21:15 | 15 |
| 2022.09.29. 21:30 | 15 |
| 2022.09.29. 21:45 | 15 |
| 2022.09.29. 22:00 | 15 |
| 2022.09.29. 22:15 | 15 |
| 2022.09.29. 22:30 | 15 |
| 2022.09.29. 22:45 | 15 |
| 2022.09.29. 23:00 | 15 |
| 2022.09.29. 23:15 | 15 |
| 2022.09.29. 23:30 | 15 |
| 2022.09.29. 23:45 | 15 |
| 2022.09.30. 00:00 | 15 |
| 2022.09.30. 00:15 | 15 |
| 2022.09.30. 00:30 | 15 |
| 2022.09.30. 00:45 | 15 |
| 2022.09.30. 01:00 | 15 |
| 2022.09.30. 01:15 | 15 |
| 2022.09.30. 01:30 | 15 |
| 2022.09.30. 01:45 | 15 |
| 2022.09.30. 02:00 | 15 |
| 2022.09.30. 02:15 | 15 |
| 2022.09.30. 02:30 | 15 |
| 2022.09.30. 02:45 | 15 |
| 2022.09.30. 03:00 | 15 |
| 2022.09.30. 03:15 | 15 |
| 2022.09.30. 03:30 | 15 |
| 2022.09.30. 03:45 | 15 |
| 2022.09.30. 04:00 | 15 |
| 2022.09.30. 04:15 | 15 |
| 2022.09.30. 04:30 | 15 |
| 2022.09.30. 04:45 | 15 |
| 2022.09.30. 05:00 | 15 |
| 2022.09.30. 05:15 | 15 |
| 2022.09.30. 05:30 | 15 |
| 2022.09.30. 05:45 | 15 |
| 2022.09.30. 06:00 | 15 |
| 2022.09.30. 06:15 | 15 |
| 2022.09.30. 06:30 | 15 |
| 2022.09.30. 06:45 | 15 |
| 2022.09.30. 07:00 | 15 |
| 2022.09.30. 07:15 | 15 |
| 2022.09.30. 07:30 | 15 |
| 2022.09.30. 07:45 | 15 |
| 2022.09.30. 08:00 | 15 |
| 2022.09.30. 08:15 | 15 |
| 2022.09.30. 08:30 | 15 |
| 2022.09.30. 08:45 | 15 |
| 2022.09.30. 09:00 | 15 |
| 2022.09.30. 09:15 | 15 |
| 2022.09.30. 09:30 | 15 |
| 2022.09.30. 09:45 | 15 |
| 2022.09.30. 10:00 | 15 |
| 2022.09.30. 10:15 | 15 |
| 2022.09.30. 10:30 | 15 |
| 2022.09.30. 10:45 | 15 |
| 2022.09.30. 11:00 | 15 |
| 2022.09.30. 11:15 | 15 |
| 2022.09.30. 11:30 | 15 |
| 2022.09.30. 11:45 | 15 |
| 2022.09.30. 12:00 | 15 |
| 2022.09.30. 12:15 | 15 |
| 2022.09.30. 12:30 | 15 |
| 2022.09.30. 12:45 | 15 |
| 2022.09.30. 13:00 | 15 |
| 2022.09.30. 13:15 | 15 |
| 2022.09.30. 13:30 | 15 |
| 2022.09.30. 13:45 | 15 |
| 2022.09.30. 14:00 | 15 |
| 2022.09.30. 14:15 | 15 |
| 2022.09.30. 14:30 | 15 |
| 2022.09.30. 14:45 | 15 |
| 2022.09.30. 15:00 | 15 |
| 2022.09.30. 15:15 | 15 |
| 2022.09.30. 15:30 | 15 |
| 2022.09.30. 15:45 | 15 |
| 2022.09.30. 16:00 | 15 |
| 2022.09.30. 16:15 | 15 |
| 2022.09.30. 16:30 | 15 |
| 2022.09.30. 16:45 | 15 |
| 2022.09.30. 17:00 | 15 |
| 2022.09.30. 17:15 | 15 |
| 2022.09.30. 17:30 | 15 |
| 2022.09.30. 17:45 | 15 |
| 2022.09.30. 18:00 | 15 |
| 2022.09.30. 18:15 | 15 |
| 2022.09.30. 18:30 | 15 |
| 2022.09.30. 18:45 | 15 |
| 2022.09.30. 19:00 | 15 |
| 2022.09.30. 19:15 | 15 |
| 2022.09.30. 19:30 | 15 |
| 2022.09.30. 19:45 | 15 |
| 2022.09.30. 20:00 | 15 |
| 2022.09.30. 20:15 | 15 |
| 2022.09.30. 20:30 | 15 |
| 2022.09.30. 20:45 | 15 |
| 2022.09.30. 21:00 | 15 |
| 2022.09.30. 21:15 | 15 |
| 2022.09.30. 21:30 | 15 |
| 2022.09.30. 21:45 | 15 |
| 2022.09.30. 22:00 | 15 |
| 2022.09.30. 22:15 | 15 |
| 2022.09.30. 22:30 | 15 |
| 2022.09.30. 22:45 | 15 |
| 2022.09.30. 23:00 | 15 |
| 2022.09.30. 23:15 | 15 |
| 2022.09.30. 23:30 | 15 |
| 2022.09.30. 23:45 | 15 |
| 2022.10.01. 00:00 | 15 |
| 2022.10.01. 00:15 | 15 |
| 2022.10.01. 00:30 | 15 |
| 2022.10.01. 00:45 | 15 |
| 2022.10.01. 01:00 | 15 |
| 2022.10.01. 01:15 | 15 |
| 2022.10.01. 01:30 | 15 |
| 2022.10.01. 01:45 | 15 |
| 2022.10.01. 02:00 | 15 |
| 2022.10.01. 02:15 | 15 |
| 2022.10.01. 02:30 | 15 |
| 2022.10.01. 02:45 | 15 |
| 2022.10.01. 03:00 | 15 |
| 2022.10.01. 03:15 | 15 |
| 2022.10.01. 03:30 | 15 |
| 2022.10.01. 03:45 | 15 |
| 2022.10.01. 04:00 | 15 |
| 2022.10.01. 04:15 | 15 |
| 2022.10.01. 04:30 | 15 |
| 2022.10.01. 04:45 | 15 |
| 2022.10.01. 05:00 | 15 |
| 2022.10.01. 05:15 | 15 |
| 2022.10.01. 05:30 | 15 |
| 2022.10.01. 05:45 | 15 |
| 2022.10.01. 06:00 | 15 |
| 2022.10.01. 06:15 | 15 |
| 2022.10.01. 06:30 | 15 |
| 2022.10.01. 06:45 | 15 |
| 2022.10.01. 07:00 | 15 |
| 2022.10.01. 07:15 | 15 |
| 2022.10.01. 07:30 | 15 |
| 2022.10.01. 07:45 | 15 |
| 2022.10.01. 08:00 | 15 |
| 2022.10.01. 08:15 | 15 |
| 2022.10.01. 08:30 | 15 |
| 2022.10.01. 08:45 | 15 |
| 2022.10.01. 09:00 | 15 |
| 2022.10.01. 09:15 | 15 |
| 2022.10.01. 09:30 | 15 |
| 2022.10.01. 09:45 | 15 |
| 2022.10.01. 10:00 | 15 |
| 2022.10.01. 10:15 | 15 |
| 2022.10.01. 10:30 | 15 |
| 2022.10.01. 10:45 | 15 |
| 2022.10.01. 11:00 | 15 |
| 2022.10.01. 11:15 | 15 |
| 2022.10.01. 11:30 | 15 |
| 2022.10.01. 11:45 | 15 |
| 2022.10.01. 12:00 | 15 |
| 2022.10.01. 12:15 | 15 |
| 2022.10.01. 12:30 | 15 |
| 2022.10.01. 12:45 | 15 |
| 2022.10.01. 13:00 | 15 |
| 2022.10.01. 13:15 | 15 |
| 2022.10.01. 13:30 | 15 |
| 2022.10.01. 13:45 | 15 |
| 2022.10.01. 14:00 | 15 |
| 2022.10.01. 14:15 | 15 |
| 2022.10.01. 14:30 | 15 |
| 2022.10.01. 14:45 | 15 |
| 2022.10.01. 15:00 | 15 |
| 2022.10.01. 15:15 | 15 |
| 2022.10.01. 15:30 | 15 |
| 2022.10.01. 15:45 | 15 |
| 2022.10.01. 16:00 | 15 |
| 2022.10.01. 16:15 | 15 |
| 2022.10.01. 16:30 | 15 |
| 2022.10.01. 16:45 | 15 |
| 2022.10.01. 17:00 | 15 |
| 2022.10.01. 17:15 | 15 |
| 2022.10.01. 17:30 | 15 |
| 2022.10.01. 17:45 | 15 |
| 2022.10.01. 18:00 | 15 |
| 2022.10.01. 18:15 | 15 |
| 2022.10.01. 18:30 | 15 |
| 2022.10.01. 18:45 | 15 |
| 2022.10.01. 19:00 | 15 |
| 2022.10.01. 19:15 | 15 |
| 2022.10.01. 19:30 | 15 |
| 2022.10.01. 19:45 | 15 |
| 2022.10.01. 20:00 | 15 |
| 2022.10.01. 20:15 | 15 |
| 2022.10.01. 20:30 | 15 |
| 2022.10.01. 20:45 | 15 |
| 2022.10.01. 21:00 | 15 |
| 2022.10.01. 21:15 | 15 |
| 2022.10.01. 21:30 | 15 |
| 2022.10.01. 21:45 | 15 |
| 2022.10.01. 22:00 | 15 |
| 2022.10.01. 22:15 | 15 |
| 2022.10.01. 22:30 | 15 |
| 2022.10.01. 22:45 | 15 |
| 2022.10.01. 23:00 | 15 |
| 2022.10.01. 23:15 | 15 |
| 2022.10.01. 23:30 | 15 |
| 2022.10.01. 23:45 | 15 |
| 2022.10.02. 00:00 | 15 |
| 2022.10.02. 00:15 | 15 |
| 2022.10.02. 00:30 | 15 |
| 2022.10.02. 00:45 | 15 |
| 2022.10.02. 01:00 | 15 |
| 2022.10.02. 01:15 | 15 |
| 2022.10.02. 01:30 | 15 |
| 2022.10.02. 01:45 | 15 |
| 2022.10.02. 02:00 | 15 |
| 2022.10.02. 02:15 | 15 |
| 2022.10.02. 02:30 | 15 |
| 2022.10.02. 02:45 | 15 |
| 2022.10.02. 03:00 | 15 |
| 2022.10.02. 03:15 | 15 |
| 2022.10.02. 03:30 | 15 |
| 2022.10.02. 03:45 | 15 |
| 2022.10.02. 04:00 | 15 |
| 2022.10.02. 04:15 | 15 |
| 2022.10.02. 04:30 | 15 |
| 2022.10.02. 04:45 | 15 |
| 2022.10.02. 05:00 | 15 |
| 2022.10.02. 05:15 | 15 |
| 2022.10.02. 05:30 | 15 |
| 2022.10.02. 05:45 | 15 |
| 2022.10.02. 06:00 | 15 |
| 2022.10.02. 06:15 | 15 |
| 2022.10.02. 06:30 | 15 |
| 2022.10.02. 06:45 | 15 |
| 2022.10.02. 07:00 | 15 |
| 2022.10.02. 07:15 | 15 |
| 2022.10.02. 07:30 | 15 |
| 2022.10.02. 07:45 | 15 |
| 2022.10.02. 08:00 | 15 |
| 2022.10.02. 08:15 | 15 |
| 2022.10.02. 08:30 | 15 |
| 2022.10.02. 08:45 | 15 |
| 2022.10.02. 09:00 | 15 |
| 2022.10.02. 09:15 | 15 |
| 2022.10.02. 09:30 | 15 |
| 2022.10.02. 09:45 | 15 |
| 2022.10.02. 10:00 | 15 |
| 2022.10.02. 10:15 | 15 |
| 2022.10.02. 10:30 | 15 |
| 2022.10.02. 10:45 | 15 |
| 2022.10.02. 11:00 | 15 |
| 2022.10.02. 11:15 | 15 |
| 2022.10.02. 11:30 | 15 |
| 2022.10.02. 11:45 | 15 |
| 2022.10.02. 12:00 | 15 |
| 2022.10.02. 12:15 | 15 |
| 2022.10.02. 12:30 | 15 |
| 2022.10.02. 12:45 | 15 |
| 2022.10.02. 13:00 | 15 |
| 2022.10.02. 13:15 | 15 |
| 2022.10.02. 13:30 | 15 |
| 2022.10.02. 13:45 | 15 |
| 2022.10.02. 14:00 | 15 |
| 2022.10.02. 14:15 | 15 |
| 2022.10.02. 14:30 | 15 |
| 2022.10.02. 14:45 | 15 |
| 2022.10.02. 15:00 | 15 |
| 2022.10.02. 15:15 | 15 |
| 2022.10.02. 15:30 | 15 |
| 2022.10.02. 15:45 | 15 |
| 2022.10.02. 16:00 | 15 |
| 2022.10.02. 16:15 | 15 |
| 2022.10.02. 16:30 | 15 |
| 2022.10.02. 16:45 | 15 |
| 2022.10.02. 17:00 | 15 |
| 2022.10.02. 17:15 | 15 |
| 2022.10.02. 17:30 | 15 |
| 2022.10.02. 17:45 | 15 |
| 2022.10.02. 18:00 | 15 |
| 2022.10.02. 18:15 | 15 |
| 2022.10.02. 18:30 | 15 |
| 2022.10.02. 18:45 | 15 |
| 2022.10.02. 19:00 | 15 |
| 2022.10.02. 19:15 | 15 |
| 2022.10.02. 19:30 | 15 |
| 2022.10.02. 19:45 | 15 |
| 2022.10.02. 20:00 | 15 |
| 2022.10.02. 20:15 | 15 |
| 2022.10.02. 20:30 | 15 |
| 2022.10.02. 20:45 | 15 |
| 2022.10.02. 21:00 | 15 |
| 2022.10.02. 21:15 | 15 |
| 2022.10.02. 21:30 | 15 |
| 2022.10.02. 21:45 | 15 |
| 2022.10.02. 22:00 | 15 |
| 2022.10.02. 22:15 | 15 |
| 2022.10.02. 22:30 | 15 |
| 2022.10.02. 22:45 | 15 |
| 2022.10.02. 23:00 | 15 |
| 2022.10.02. 23:15 | 15 |
| 2022.10.02. 23:30 | 15 |
| 2022.10.02. 23:45 | 15 |
| 2022.10.03. 00:00 | 15 |
| 2022.10.03. 00:15 | 15 |
| 2022.10.03. 00:30 | 15 |
| 2022.10.03. 00:45 | 15 |
| 2022.10.03. 01:00 | 15 |
| 2022.10.03. 01:15 | 15 |
| 2022.10.03. 01:30 | 15 |
| 2022.10.03. 01:45 | 15 |
| 2022.10.03. 02:00 | 15 |
| 2022.10.03. 02:15 | 15 |
| 2022.10.03. 02:30 | 15 |
| 2022.10.03. 02:45 | 15 |
| 2022.10.03. 03:00 | 15 |
| 2022.10.03. 03:15 | 15 |
| 2022.10.03. 03:30 | 15 |
| 2022.10.03. 03:45 | 15 |
| 2022.10.03. 04:00 | 15 |
| 2022.10.03. 04:15 | 15 |
| 2022.10.03. 04:30 | 15 |
| 2022.10.03. 04:45 | 15 |
| 2022.10.03. 05:00 | 15 |
| 2022.10.03. 05:15 | 15 |
| 2022.10.03. 05:30 | 15 |
| 2022.10.03. 05:45 | 15 |
| 2022.10.03. 06:00 | 15 |
| 2022.10.03. 06:15 | 15 |
| 2022.10.03. 06:30 | 15 |
| 2022.10.03. 06:45 | 15 |
| 2022.10.03. 07:00 | 15 |
| 2022.10.03. 07:15 | 15 |
| 2022.10.03. 07:30 | 15 |
| 2022.10.03. 07:45 | 15 |
| 2022.10.03. 08:00 | 15 |
| 2022.10.03. 08:15 | 15 |
| 2022.10.03. 08:30 | 15 |
| 2022.10.03. 08:45 | 15 |
| 2022.10.03. 09:00 | 15 |
| 2022.10.03. 09:15 | 15 |
| 2022.10.03. 09:30 | 15 |
| 2022.10.03. 09:45 | 15 |
| 2022.10.03. 10:00 | 15 |
| 2022.10.03. 10:15 | 15 |
| 2022.10.03. 10:30 | 15 |
| 2022.10.03. 10:45 | 15 |
| 2022.10.03. 11:00 | 15 |
| 2022.10.03. 11:15 | 15 |
| 2022.10.03. 11:30 | 15 |
| 2022.10.03. 11:45 | 15 |
| 2022.10.03. 12:00 | 15 |
| 2022.10.03. 12:15 | 15 |
| 2022.10.03. 12:30 | 15 |
| 2022.10.03. 12:45 | 15 |
| 2022.10.03. 13:00 | 15 |
| 2022.10.03. 13:15 | 15 |
| 2022.10.03. 13:30 | 15 |
| 2022.10.03. 13:45 | 15 |
| 2022.10.03. 14:00 | 15 |
| 2022.10.03. 14:15 | 15 |
| 2022.10.03. 14:30 | 15 |
| 2022.10.03. 14:45 | 15 |
| 2022.10.03. 15:00 | 15 |
| 2022.10.03. 15:15 | 15 |
| 2022.10.03. 15:30 | 15 |
| 2022.10.03. 15:45 | 15 |
| 2022.10.03. 16:00 | 15 |
| 2022.10.03. 16:15 | 15 |
| 2022.10.03. 16:30 | 15 |
| 2022.10.03. 16:45 | 15 |
| 2022.10.03. 17:00 | 15 |
| 2022.10.03. 17:15 | 15 |
| 2022.10.03. 17:30 | 15 |
| 2022.10.03. 17:45 | 15 |
| 2022.10.03. 18:00 | 15 |
| 2022.10.03. 18:15 | 15 |
| 2022.10.03. 18:30 | 15 |
| 2022.10.03. 18:45 | 15 |
| 2022.10.03. 19:00 | 15 |
| 2022.10.03. 19:15 | 15 |
| 2022.10.03. 19:30 | 15 |
| 2022.10.03. 19:45 | 15 |
| 2022.10.03. 20:00 | 15 |
| 2022.10.03. 20:15 | 15 |
| 2022.10.03. 20:30 | 15 |
| 2022.10.03. 20:45 | 15 |
| 2022.10.03. 21:00 | 15 |
| 2022.10.03. 21:15 | 15 |
| 2022.10.03. 21:30 | 15 |
| 2022.10.03. 21:45 | 15 |
| 2022.10.03. 22:00 | 15 |
| 2022.10.03. 22:15 | 15 |
| 2022.10.03. 22:30 | 15 |
| 2022.10.03. 22:45 | 15 |
| 2022.10.03. 23:00 | 15 |
| 2022.10.03. 23:15 | 15 |
| 2022.10.03. 23:30 | 15 |
| 2022.10.03. 23:45 | 15 |
| 2022.10.04. 00:00 | 15 |
| 2022.10.04. 00:15 | 15 |
| 2022.10.04. 00:30 | 15 |
| 2022.10.04. 00:45 | 15 |
| 2022.10.04. 01:00 | 15 |
| 2022.10.04. 01:15 | 15 |
| 2022.10.04. 01:30 | 15 |
| 2022.10.04. 01:45 | 15 |
| 2022.10.04. 02:00 | 15 |
| 2022.10.04. 02:15 | 15 |
| 2022.10.04. 02:30 | 15 |
| 2022.10.04. 02:45 | 15 |
| 2022.10.04. 03:00 | 15 |
| 2022.10.04. 03:15 | 15 |
| 2022.10.04. 03:30 | 15 |
| 2022.10.04. 03:45 | 15 |
| 2022.10.04. 04:00 | 15 |
| 2022.10.04. 04:15 | 15 |
| 2022.10.04. 04:30 | 15 |
| 2022.10.04. 04:45 | 15 |
| 2022.10.04. 05:00 | 15 |
| 2022.10.04. 05:15 | 15 |
| 2022.10.04. 05:30 | 15 |
| 2022.10.04. 05:45 | 15 |
| 2022.10.04. 06:00 | 15 |
| 2022.10.04. 06:15 | 15 |
| 2022.10.04. 06:30 | 15 |
| 2022.10.04. 06:45 | 15 |
| 2022.10.04. 07:00 | 15 |
| 2022.10.04. 07:15 | 15 |
| 2022.10.04. 07:30 | 15 |
| 2022.10.04. 07:45 | 15 |
| 2022.10.04. 08:00 | 15 |
| 2022.10.04. 08:15 | 15 |
| 2022.10.04. 08:30 | 15 |
| 2022.10.04. 08:45 | 15 |
| 2022.10.04. 09:00 | 15 |
| 2022.10.04. 09:15 | 15 |
| 2022.10.04. 09:30 | 15 |
| 2022.10.04. 09:45 | 15 |
| 2022.10.04. 10:00 | 15 |
| 2022.10.04. 10:15 | 15 |
| 2022.10.04. 10:30 | 15 |
| 2022.10.04. 10:45 | 15 |
| 2022.10.04. 11:00 | 15 |
| 2022.10.04. 11:15 | 15 |
| 2022.10.04. 11:30 | 15 |
| 2022.10.04. 11:45 | 15 |
| 2022.10.04. 12:00 | 15 |
| 2022.10.04. 12:15 | 15 |
| 2022.10.04. 12:30 | 15 |
| 2022.10.04. 12:45 | 15 |
| 2022.10.04. 13:00 | 15 |
| 2022.10.04. 13:15 | 15 |
| 2022.10.04. 13:30 | 15 |
| 2022.10.04. 13:45 | 15 |
| 2022.10.04. 14:00 | 15 |
| 2022.10.04. 14:15 | 15 |
| 2022.10.04. 14:30 | 15 |
| 2022.10.04. 14:45 | 15 |
| 2022.10.04. 15:00 | 15 |
| 2022.10.04. 15:15 | 15 |
| 2022.10.04. 15:30 | 15 |
| 2022.10.04. 15:45 | 15 |
| 2022.10.04. 16:00 | 15 |
| 2022.10.04. 16:15 | 15 |
| 2022.10.04. 16:30 | 15 |
| 2022.10.04. 16:45 | 15 |
| 2022.10.04. 17:00 | 15 |
| 2022.10.04. 17:15 | 15 |
| 2022.10.04. 17:30 | 15 |
| 2022.10.04. 17:45 | 15 |
| 2022.10.04. 18:00 | 15 |
| 2022.10.04. 18:15 | 15 |
| 2022.10.04. 18:30 | 15 |
| 2022.10.04. 18:45 | 15 |
| 2022.10.04. 19:00 | 15 |
| 2022.10.04. 19:15 | 15 |
| 2022.10.04. 19:30 | 15 |
| 2022.10.04. 19:45 | 15 |
| 2022.10.04. 20:00 | 15 |
| 2022.10.04. 20:15 | 15 |
| 2022.10.04. 20:30 | 15 |
| 2022.10.04. 20:45 | 15 |
| 2022.10.04. 21:00 | 15 |
| 2022.10.04. 21:15 | 15 |
| 2022.10.04. 21:30 | 15 |
| 2022.10.04. 21:45 | 15 |
| 2022.10.04. 22:00 | 15 |
| 2022.10.04. 22:15 | 15 |
| 2022.10.04. 22:30 | 15 |
| 2022.10.04. 22:45 | 15 |
| 2022.10.04. 23:00 | 15 |
| 2022.10.04. 23:15 | 15 |
| 2022.10.04. 23:30 | 15 |
| 2022.10.04. 23:45 | 15 |
| 2022.10.05. 00:00 | 15 |
| 2022.10.05. 00:15 | 15 |
| 2022.10.05. 00:30 | 15 |
| 2022.10.05. 00:45 | 15 |
| 2022.10.05. 01:00 | 15 |
| 2022.10.05. 01:15 | 15 |
| 2022.10.05. 01:30 | 15 |
| 2022.10.05. 01:45 | 15 |
| 2022.10.05. 02:00 | 15 |
| 2022.10.05. 02:15 | 15 |
| 2022.10.05. 02:30 | 15 |
| 2022.10.05. 02:45 | 15 |
| 2022.10.05. 03:00 | 15 |
| 2022.10.05. 03:15 | 15 |
| 2022.10.05. 03:30 | 15 |
| 2022.10.05. 03:45 | 15 |
| 2022.10.05. 04:00 | 15 |
| 2022.10.05. 04:15 | 15 |
| 2022.10.05. 04:30 | 15 |
| 2022.10.05. 04:45 | 15 |
| 2022.10.05. 05:00 | 15 |
| 2022.10.05. 05:15 | 15 |
| 2022.10.05. 05:30 | 15 |
| 2022.10.05. 05:45 | 15 |
| 2022.10.05. 06:00 | 15 |
| 2022.10.05. 06:15 | 15 |
| 2022.10.05. 06:30 | 15 |
| 2022.10.05. 06:45 | 15 |
| 2022.10.05. 07:00 | 15 |
| 2022.10.05. 07:15 | 15 |
| 2022.10.05. 07:30 | 15 |
| 2022.10.05. 07:45 | 15 |
| 2022.10.05. 08:00 | 15 |
| 2022.10.05. 08:15 | 15 |
| 2022.10.05. 08:30 | 15 |
| 2022.10.05. 08:45 | 15 |
| 2022.10.05. 09:00 | 15 |
| 2022.10.05. 09:15 | 15 |
| 2022.10.05. 09:30 | 15 |
| 2022.10.05. 09:45 | 15 |
| 2022.10.05. 10:00 | 15 |
| 2022.10.05. 10:15 | 15 |
| 2022.10.05. 10:30 | 15 |
| 2022.10.05. 10:45 | 15 |
| 2022.10.05. 11:00 | 15 |
| 2022.10.05. 11:15 | 15 |
| 2022.10.05. 11:30 | 15 |
| 2022.10.05. 11:45 | 15 |
| 2022.10.05. 12:00 | 15 |
| 2022.10.05. 12:15 | 15 |
| 2022.10.05. 12:30 | 15 |
| 2022.10.05. 12:45 | 15 |
| 2022.10.05. 13:00 | 15 |
| 2022.10.05. 13:15 | 15 |
| 2022.10.05. 13:30 | 15 |
| 2022.10.05. 13:45 | 15 |
| 2022.10.05. 14:00 | 15 |
| 2022.10.05. 14:15 | 15 |
| 2022.10.05. 14:30 | 15 |
| 2022.10.05. 14:45 | 15 |
| 2022.10.05. 15:00 | 15 |
| 2022.10.05. 15:15 | 15 |
| 2022.10.05. 15:30 | 15 |
| 2022.10.05. 15:45 | 15 |
| 2022.10.05. 16:00 | 15 |
| 2022.10.05. 16:15 | 15 |
| 2022.10.05. 16:30 | 15 |
| 2022.10.05. 16:45 | 15 |
| 2022.10.05. 17:00 | 15 |
| 2022.10.05. 17:15 | 15 |
| 2022.10.05. 17:30 | 15 |
| 2022.10.05. 17:45 | 15 |
| 2022.10.05. 18:00 | 15 |
| 2022.10.05. 18:15 | 15 |
| 2022.10.05. 18:30 | 15 |
| 2022.10.05. 18:45 | 15 |
| 2022.10.05. 19:00 | 15 |
| 2022.10.05. 19:15 | 15 |
| 2022.10.05. 19:30 | 15 |
| 2022.10.05. 19:45 | 15 |
| 2022.10.05. 20:00 | 15 |
| 2022.10.05. 20:15 | 15 |
| 2022.10.05. 20:30 | 15 |
| 2022.10.05. 20:45 | 15 |
| 2022.10.05. 21:00 | 15 |
| 2022.10.05. 21:15 | 15 |
| 2022.10.05. 21:30 | 15 |
| 2022.10.05. 21:45 | 15 |
| 2022.10.05. 22:00 | 15 |
| 2022.10.05. 22:15 | 15 |
| 2022.10.05. 22:30 | 15 |
| 2022.10.05. 22:45 | 15 |
| 2022.10.05. 23:00 | 15 |
| 2022.10.05. 23:15 | 15 |
| 2022.10.05. 23:30 | 15 |
| 2022.10.05. 23:45 | 15 |
| 2022.10.06. 00:00 | 15 |
| 2022.10.06. 00:15 | 15 |
| 2022.10.06. 00:30 | 15 |
| 2022.10.06. 00:45 | 15 |
| 2022.10.06. 01:00 | 15 |
| 2022.10.06. 01:15 | 15 |
| 2022.10.06. 01:30 | 15 |
| 2022.10.06. 01:45 | 15 |
| 2022.10.06. 02:00 | 15 |
| 2022.10.06. 02:15 | 15 |
| 2022.10.06. 02:30 | 15 |
| 2022.10.06. 02:45 | 15 |
| 2022.10.06. 03:00 | 15 |
| 2022.10.06. 03:15 | 15 |
| 2022.10.06. 03:30 | 15 |
| 2022.10.06. 03:45 | 15 |
| 2022.10.06. 04:00 | 15 |
| 2022.10.06. 04:15 | 15 |
| 2022.10.06. 04:30 | 15 |
| 2022.10.06. 04:45 | 15 |
| 2022.10.06. 05:00 | 15 |
| 2022.10.06. 05:15 | 15 |
| 2022.10.06. 05:30 | 15 |
| 2022.10.06. 05:45 | 15 |
| 2022.10.06. 06:00 | 15 |
| 2022.10.06. 06:15 | 15 |
| 2022.10.06. 06:30 | 15 |
| 2022.10.06. 06:45 | 15 |
| 2022.10.06. 07:00 | 15 |
| 2022.10.06. 07:15 | 15 |
| 2022.10.06. 07:30 | 15 |
| 2022.10.06. 07:45 | 15 |
| 2022.10.06. 08:00 | 15 |
| 2022.10.06. 08:15 | 15 |
| 2022.10.06. 08:30 | 15 |
| 2022.10.06. 08:45 | 15 |
| 2022.10.06. 09:00 | 15 |
| 2022.10.06. 09:15 | 15 |
| 2022.10.06. 09:30 | 15 |
| 2022.10.06. 09:45 | 15 |
| 2022.10.06. 10:00 | 15 |
| 2022.10.06. 10:15 | 15 |
| 2022.10.06. 10:30 | 15 |
| 2022.10.06. 10:45 | 15 |
| 2022.10.06. 11:00 | 15 |
| 2022.10.06. 11:15 | 15 |
| 2022.10.06. 11:30 | 15 |
| 2022.10.06. 11:45 | 15 |
| 2022.10.06. 12:00 | 15 |
| 2022.10.06. 12:15 | 15 |
| 2022.10.06. 12:30 | 15 |
| 2022.10.06. 12:45 | 15 |
| 2022.10.06. 13:00 | 15 |
| 2022.10.06. 13:15 | 15 |
| 2022.10.06. 13:30 | 15 |
| 2022.10.06. 13:45 | 15 |
| 2022.10.06. 14:00 | 15 |
| 2022.10.06. 14:15 | 15 |
| 2022.10.06. 14:30 | 15 |
| 2022.10.06. 14:45 | 15 |
| 2022.10.06. 15:00 | 15 |
| 2022.10.06. 15:15 | 15 |
| 2022.10.06. 15:30 | 15 |
| 2022.10.06. 15:45 | 15 |
| 2022.10.06. 16:00 | 15 |
| 2022.10.06. 16:15 | 15 |
| 2022.10.06. 16:30 | 15 |
| 2022.10.06. 16:45 | 15 |
| 2022.10.06. 17:00 | 15 |
| 2022.10.06. 17:15 | 15 |
| 2022.10.06. 17:30 | 15 |
| 2022.10.06. 17:45 | 15 |
| 2022.10.06. 18:00 | 15 |
| 2022.10.06. 18:15 | 15 |
| 2022.10.06. 18:30 | 15 |
| 2022.10.06. 18:45 | 15 |
| 2022.10.06. 19:00 | 15 |
| 2022.10.06. 19:15 | 15 |
| 2022.10.06. 19:30 | 15 |
| 2022.10.06. 19:45 | 15 |
| 2022.10.06. 20:00 | 15 |
| 2022.10.06. 20:15 | 15 |
| 2022.10.06. 20:30 | 15 |
| 2022.10.06. 20:45 | 15 |
| 2022.10.06. 21:00 | 15 |
| 2022.10.06. 21:15 | 15 |
| 2022.10.06. 21:30 | 15 |
| 2022.10.06. 21:45 | 15 |
| 2022.10.06. 22:00 | 15 |
| 2022.10.06. 22:15 | 15 |
| 2022.10.06. 22:30 | 15 |
| 2022.10.06. 22:45 | 15 |
| 2022.10.06. 23:00 | 15 |
| 2022.10.06. 23:15 | 15 |
| 2022.10.06. 23:30 | 15 |
| 2022.10.06. 23:45 | 15 |
| 2022.10.07. 00:00 | 15 |
| 2022.10.07. 00:15 | 15 |
| 2022.10.07. 00:30 | 15 |
| 2022.10.07. 00:45 | 15 |
| 2022.10.07. 01:00 | 15 |
| 2022.10.07. 01:15 | 15 |
| 2022.10.07. 01:30 | 15 |
| 2022.10.07. 01:45 | 15 |
| 2022.10.07. 02:00 | 15 |
| 2022.10.07. 02:15 | 15 |
| 2022.10.07. 02:30 | 15 |
| 2022.10.07. 02:45 | 15 |
| 2022.10.07. 03:00 | 15 |
| 2022.10.07. 03:15 | 15 |
| 2022.10.07. 03:30 | 15 |
| 2022.10.07. 03:45 | 15 |
| 2022.10.07. 04:00 | 15 |
| 2022.10.07. 04:15 | 15 |
| 2022.10.07. 04:30 | 15 |
| 2022.10.07. 04:45 | 15 |
| 2022.10.07. 05:00 | 15 |
| 2022.10.07. 05:15 | 15 |
| 2022.10.07. 05:30 | 15 |
| 2022.10.07. 05:45 | 15 |
| 2022.10.07. 06:00 | 15 |
| 2022.10.07. 06:15 | 15 |
| 2022.10.07. 06:30 | 15 |
| 2022.10.07. 06:45 | 15 |
| 2022.10.07. 07:00 | 15 |
| 2022.10.07. 07:15 | 15 |
| 2022.10.07. 07:30 | 15 |
| 2022.10.07. 07:45 | 15 |
| 2022.10.07. 08:00 | 15 |
| 2022.10.07. 08:15 | 15 |
| 2022.10.07. 08:30 | 15 |
| 2022.10.07. 08:45 | 15 |
| 2022.10.07. 09:00 | 15 |
| 2022.10.07. 09:15 | 15 |
| 2022.10.07. 09:30 | 15 |
| 2022.10.07. 09:45 | 15 |
| 2022.10.07. 10:00 | 15 |
| 2022.10.07. 10:15 | 15 |
| 2022.10.07. 10:30 | 15 |
| 2022.10.07. 10:45 | 15 |
| 2022.10.07. 11:00 | 15 |
| 2022.10.07. 11:15 | 15 |
| 2022.10.07. 11:30 | 15 |
| 2022.10.07. 11:45 | 15 |
| 2022.10.07. 12:00 | 15 |
| 2022.10.07. 12:15 | 15 |
| 2022.10.07. 12:30 | 15 |
| 2022.10.07. 12:45 | 15 |
| 2022.10.07. 13:00 | 15 |
| 2022.10.07. 13:15 | 15 |
| 2022.10.07. 13:30 | 15 |
| 2022.10.07. 13:45 | 15 |
| 2022.10.07. 14:00 | 15 |
| 2022.10.07. 14:15 | 15 |
| 2022.10.07. 14:30 | 15 |
| 2022.10.07. 14:45 | 15 |
| 2022.10.07. 15:00 | 15 |
| 2022.10.07. 15:15 | 15 |
| 2022.10.07. 15:30 | 15 |
| 2022.10.07. 15:45 | 15 |
| 2022.10.07. 16:00 | 15 |
| 2022.10.07. 16:15 | 15 |
| 2022.10.07. 16:30 | 15 |
| 2022.10.07. 16:45 | 15 |
| 2022.10.07. 17:00 | 15 |
| 2022.10.07. 17:15 | 15 |
| 2022.10.07. 17:30 | 15 |
| 2022.10.07. 17:45 | 15 |
| 2022.10.07. 18:00 | 15 |
| 2022.10.07. 18:15 | 15 |
| 2022.10.07. 18:30 | 15 |
| 2022.10.07. 18:45 | 15 |
| 2022.10.07. 19:00 | 15 |
| 2022.10.07. 19:15 | 15 |
| 2022.10.07. 19:30 | 15 |
| 2022.10.07. 19:45 | 15 |
| 2022.10.07. 20:00 | 15 |
| 2022.10.07. 20:15 | 15 |
| 2022.10.07. 20:30 | 15 |
| 2022.10.07. 20:45 | 15 |
| 2022.10.07. 21:00 | 15 |
| 2022.10.07. 21:15 | 15 |
| 2022.10.07. 21:30 | 15 |
| 2022.10.07. 21:45 | 15 |
| 2022.10.07. 22:00 | 15 |
| 2022.10.07. 22:15 | 15 |
| 2022.10.07. 22:30 | 15 |
| 2022.10.07. 22:45 | 15 |
| 2022.10.07. 23:00 | 15 |
| 2022.10.07. 23:15 | 15 |
| 2022.10.07. 23:30 | 15 |
| 2022.10.07. 23:45 | 15 |
| 2022.10.08. 00:00 | 15 |
| 2022.10.08. 00:15 | 15 |
| 2022.10.08. 00:30 | 15 |
| 2022.10.08. 00:45 | 15 |
| 2022.10.08. 01:00 | 15 |
| 2022.10.08. 01:15 | 15 |
| 2022.10.08. 01:30 | 15 |
| 2022.10.08. 01:45 | 15 |
| 2022.10.08. 02:00 | 15 |
| 2022.10.08. 02:15 | 15 |
| 2022.10.08. 02:30 | 15 |
| 2022.10.08. 02:45 | 15 |
| 2022.10.08. 03:00 | 15 |
| 2022.10.08. 03:15 | 15 |
| 2022.10.08. 03:30 | 15 |
| 2022.10.08. 03:45 | 15 |
| 2022.10.08. 04:00 | 15 |
| 2022.10.08. 04:15 | 15 |
| 2022.10.08. 04:30 | 15 |
| 2022.10.08. 04:45 | 15 |
| 2022.10.08. 05:00 | 15 |
| 2022.10.08. 05:15 | 15 |
| 2022.10.08. 05:30 | 15 |
| 2022.10.08. 05:45 | 15 |
| 2022.10.08. 06:00 | 15 |
| 2022.10.08. 06:15 | 15 |
| 2022.10.08. 06:30 | 15 |
| 2022.10.08. 06:45 | 15 |
| 2022.10.08. 07:00 | 15 |
| 2022.10.08. 07:15 | 15 |
| 2022.10.08. 07:30 | 15 |
| 2022.10.08. 07:45 | 15 |
| 2022.10.08. 08:00 | 15 |
| 2022.10.08. 08:15 | 15 |
| 2022.10.08. 08:30 | 15 |
| 2022.10.08. 08:45 | 15 |
| 2022.10.08. 09:00 | 15 |
| 2022.10.08. 09:15 | 15 |
| 2022.10.08. 09:30 | 15 |
| 2022.10.08. 09:45 | 15 |
| 2022.10.08. 10:00 | 15 |
| 2022.10.08. 10:15 | 15 |
| 2022.10.08. 10:30 | 15 |
| 2022.10.08. 10:45 | 15 |
| 2022.10.08. 11:00 | 15 |
| 2022.10.08. 11:15 | 15 |
| 2022.10.08. 11:30 | 15 |
| 2022.10.08. 11:45 | 15 |
| 2022.10.08. 12:00 | 15 |
| 2022.10.08. 12:15 | 15 |
| 2022.10.08. 12:30 | 15 |
| 2022.10.08. 12:45 | 15 |
| 2022.10.08. 13:00 | 15 |
| 2022.10.08. 13:15 | 15 |
| 2022.10.08. 13:30 | 15 |
| 2022.10.08. 13:45 | 15 |
| 2022.10.08. 14:00 | 15 |
| 2022.10.08. 14:15 | 15 |
| 2022.10.08. 14:30 | 15 |
| 2022.10.08. 14:45 | 15 |
| 2022.10.08. 15:00 | 15 |
| 2022.10.08. 15:15 | 15 |
| 2022.10.08. 15:30 | 15 |
| 2022.10.08. 15:45 | 15 |
| 2022.10.08. 16:00 | 15 |
| 2022.10.08. 16:15 | 15 |
| 2022.10.08. 16:30 | 15 |
| 2022.10.08. 16:45 | 15 |
| 2022.10.08. 17:00 | 15 |
| 2022.10.08. 17:15 | 15 |
| 2022.10.08. 17:30 | 15 |
| 2022.10.08. 17:45 | 15 |
| 2022.10.08. 18:00 | 15 |
| 2022.10.08. 18:15 | 15 |
| 2022.10.08. 18:30 | 15 |
| 2022.10.08. 18:45 | 15 |
| 2022.10.08. 19:00 | 15 |
| 2022.10.08. 19:15 | 15 |
| 2022.10.08. 19:30 | 15 |
| 2022.10.08. 19:45 | 15 |
| 2022.10.08. 20:00 | 15 |
| 2022.10.08. 20:15 | 15 |
| 2022.10.08. 20:30 | 15 |
| 2022.10.08. 20:45 | 15 |
| 2022.10.08. 21:00 | 15 |
| 2022.10.08. 21:15 | 15 |
| 2022.10.08. 21:30 | 15 |
| 2022.10.08. 21:45 | 15 |
| 2022.10.08. 22:00 | 15 |
| 2022.10.08. 22:15 | 15 |
| 2022.10.08. 22:30 | 15 |
| 2022.10.08. 22:45 | 15 |
| 2022.10.08. 23:00 | 15 |
| 2022.10.08. 23:15 | 15 |
| 2022.10.08. 23:30 | 15 |
| 2022.10.08. 23:45 | 15 |
| 2022.10.09. 00:00 | 15 |
| 2022.10.09. 00:15 | 15 |
| 2022.10.09. 00:30 | 15 |
| 2022.10.09. 00:45 | 15 |
| 2022.10.09. 01:00 | 15 |
| 2022.10.09. 01:15 | 15 |
| 2022.10.09. 01:30 | 15 |
| 2022.10.09. 01:45 | 15 |
| 2022.10.09. 02:00 | 15 |
| 2022.10.09. 02:15 | 15 |
| 2022.10.09. 02:30 | 15 |
| 2022.10.09. 02:45 | 15 |
| 2022.10.09. 03:00 | 15 |
| 2022.10.09. 03:15 | 15 |
| 2022.10.09. 03:30 | 15 |
| 2022.10.09. 03:45 | 15 |
| 2022.10.09. 04:00 | 15 |
| 2022.10.09. 04:15 | 15 |
| 2022.10.09. 04:30 | 15 |
| 2022.10.09. 04:45 | 15 |
| 2022.10.09. 05:00 | 15 |
| 2022.10.09. 05:15 | 15 |
| 2022.10.09. 05:30 | 15 |
| 2022.10.09. 05:45 | 15 |
| 2022.10.09. 06:00 | 15 |
| 2022.10.09. 06:15 | 15 |
| 2022.10.09. 06:30 | 15 |
| 2022.10.09. 06:45 | 15 |
| 2022.10.09. 07:00 | 15 |
| 2022.10.09. 07:15 | 15 |
| 2022.10.09. 07:30 | 15 |
| 2022.10.09. 07:45 | 15 |
| 2022.10.09. 08:00 | 15 |
| 2022.10.09. 08:15 | 15 |
| 2022.10.09. 08:30 | 15 |
| 2022.10.09. 08:45 | 15 |
| 2022.10.09. 09:00 | 15 |
| 2022.10.09. 09:15 | 15 |
| 2022.10.09. 09:30 | 15 |
| 2022.10.09. 09:45 | 15 |
| 2022.10.09. 10:00 | 15 |
| 2022.10.09. 10:15 | 15 |
| 2022.10.09. 10:30 | 15 |
| 2022.10.09. 10:45 | 15 |
| 2022.10.09. 11:00 | 15 |
| 2022.10.09. 11:15 | 15 |
| 2022.10.09. 11:30 | 15 |
| 2022.10.09. 11:45 | 15 |
| 2022.10.09. 12:00 | 15 |
| 2022.10.09. 12:15 | 15 |
| 2022.10.09. 12:30 | 15 |
| 2022.10.09. 12:45 | 15 |
| 2022.10.09. 13:00 | 15 |
| 2022.10.09. 13:15 | 15 |
| 2022.10.09. 13:30 | 15 |
| 2022.10.09. 13:45 | 15 |
| 2022.10.09. 14:00 | 15 |
| 2022.10.09. 14:15 | 15 |
| 2022.10.09. 14:30 | 15 |
| 2022.10.09. 14:45 | 15 |
| 2022.10.09. 15:00 | 15 |
| 2022.10.09. 15:15 | 15 |
| 2022.10.09. 15:30 | 15 |
| 2022.10.09. 15:45 | 15 |
| 2022.10.09. 16:00 | 15 |
| 2022.10.09. 16:15 | 15 |
| 2022.10.09. 16:30 | 15 |
| 2022.10.09. 16:45 | 15 |
| 2022.10.09. 17:00 | 15 |
| 2022.10.09. 17:15 | 15 |
| 2022.10.09. 17:30 | 15 |
| 2022.10.09. 17:45 | 15 |
| 2022.10.09. 18:00 | 15 |
| 2022.10.09. 18:15 | 15 |
| 2022.10.09. 18:30 | 15 |
| 2022.10.09. 18:45 | 15 |
| 2022.10.09. 19:00 | 15 |
| 2022.10.09. 19:15 | 15 |
| 2022.10.09. 19:30 | 15 |
| 2022.10.09. 19:45 | 15 |
| 2022.10.09. 20:00 | 15 |
| 2022.10.09. 20:15 | 15 |
| 2022.10.09. 20:30 | 15 |
| 2022.10.09. 20:45 | 15 |
| 2022.10.09. 21:00 | 15 |
| 2022.10.09. 21:15 | 15 |
| 2022.10.09. 21:30 | 15 |
| 2022.10.09. 21:45 | 15 |
| 2022.10.09. 22:00 | 15 |
| 2022.10.09. 22:15 | 15 |
| 2022.10.09. 22:30 | 15 |
| 2022.10.09. 22:45 | 15 |
| 2022.10.09. 23:00 | 15 |
| 2022.10.09. 23:15 | 15 |
| 2022.10.09. 23:30 | 15 |
| 2022.10.09. 23:45 | 15 |
| 2022.10.10. 00:00 | 15 |
| 2022.10.10. 00:15 | 15 |
| 2022.10.10. 00:30 | 15 |
| 2022.10.10. 00:45 | 15 |
| 2022.10.10. 01:00 | 15 |
| 2022.10.10. 01:15 | 15 |
| 2022.10.10. 01:30 | 15 |
| 2022.10.10. 01:45 | 15 |
| 2022.10.10. 02:00 | 15 |
| 2022.10.10. 02:15 | 15 |
| 2022.10.10. 02:30 | 15 |
| 2022.10.10. 02:45 | 15 |
| 2022.10.10. 03:00 | 15 |
| 2022.10.10. 03:15 | 15 |
| 2022.10.10. 03:30 | 15 |
| 2022.10.10. 03:45 | 15 |
| 2022.10.10. 04:00 | 15 |
| 2022.10.10. 04:15 | 15 |
| 2022.10.10. 04:30 | 15 |
| 2022.10.10. 04:45 | 15 |
| 2022.10.10. 05:00 | 15 |
| 2022.10.10. 05:15 | 15 |
| 2022.10.10. 05:30 | 15 |
| 2022.10.10. 05:45 | 15 |
| 2022.10.10. 06:00 | 15 |
| 2022.10.10. 06:15 | 15 |
| 2022.10.10. 06:30 | 15 |
| 2022.10.10. 06:45 | 15 |
| 2022.10.10. 07:00 | 15 |
| 2022.10.10. 07:15 | 15 |
| 2022.10.10. 07:30 | 15 |
| 2022.10.10. 07:45 | 15 |
| 2022.10.10. 08:00 | 15 |
| 2022.10.10. 08:15 | 15 |
| 2022.10.10. 08:30 | 15 |
| 2022.10.10. 08:45 | 15 |
| 2022.10.10. 09:00 | 15 |
| 2022.10.10. 09:15 | 15 |
| 2022.10.10. 09:30 | 15 |
| 2022.10.10. 09:45 | 15 |
| 2022.10.10. 10:00 | 15 |
| 2022.10.10. 10:15 | 15 |
| 2022.10.10. 10:30 | 15 |
| 2022.10.10. 10:45 | 15 |
| 2022.10.10. 11:00 | 15 |
| 2022.10.10. 11:15 | 15 |
| 2022.10.10. 11:30 | 15 |
| 2022.10.10. 11:45 | 15 |
| 2022.10.10. 12:00 | 15 |
| 2022.10.10. 12:15 | 15 |
| 2022.10.10. 12:30 | 15 |
| 2022.10.10. 12:45 | 15 |
| 2022.10.10. 13:00 | 15 |
| 2022.10.10. 13:15 | 15 |
| 2022.10.10. 13:30 | 15 |
| 2022.10.10. 13:45 | 15 |
| 2022.10.10. 14:00 | 15 |
| 2022.10.10. 14:15 | 15 |
| 2022.10.10. 14:30 | 15 |
| 2022.10.10. 14:45 | 15 |
| 2022.10.10. 15:00 | 15 |
| 2022.10.10. 15:15 | 15 |
| 2022.10.10. 15:30 | 15 |
| 2022.10.10. 15:45 | 15 |
| 2022.10.10. 16:00 | 15 |
| 2022.10.10. 16:15 | 15 |
| 2022.10.10. 16:30 | 15 |
| 2022.10.10. 16:45 | 15 |
| 2022.10.10. 17:00 | 15 |
| 2022.10.10. 17:15 | 15 |
| 2022.10.10. 17:30 | 15 |
| 2022.10.10. 17:45 | 15 |
| 2022.10.10. 18:00 | 15 |
| 2022.10.10. 18:15 | 15 |
| 2022.10.10. 18:30 | 15 |
| 2022.10.10. 18:45 | 15 |
| 2022.10.10. 19:00 | 15 |
| 2022.10.10. 19:15 | 15 |
| 2022.10.10. 19:30 | 15 |
| 2022.10.10. 19:45 | 15 |
| 2022.10.10. 20:00 | 15 |
| 2022.10.10. 20:15 | 15 |
| 2022.10.10. 20:30 | 15 |
| 2022.10.10. 20:45 | 15 |
| 2022.10.10. 21:00 | 15 |
| 2022.10.10. 21:15 | 15 |
| 2022.10.10. 21:30 | 15 |
| 2022.10.10. 21:45 | 15 |
| 2022.10.10. 22:00 | 15 |
| 2022.10.10. 22:15 | 15 |
| 2022.10.10. 22:30 | 15 |
| 2022.10.10. 22:45 | 15 |
| 2022.10.10. 23:00 | 15 |
| 2022.10.10. 23:15 | 15 |
| 2022.10.10. 23:30 | 15 |
| 2022.10.10. 23:45 | 15 |
| 2022.10.11. 00:00 | 15 |
| 2022.10.11. 00:15 | 15 |
| 2022.10.11. 00:30 | 15 |
| 2022.10.11. 00:45 | 15 |
| 2022.10.11. 01:00 | 15 |
| 2022.10.11. 01:15 | 15 |
| 2022.10.11. 01:30 | 15 |
| 2022.10.11. 01:45 | 15 |
| 2022.10.11. 02:00 | 15 |
| 2022.10.11. 02:15 | 15 |
| 2022.10.11. 02:30 | 15 |
| 2022.10.11. 02:45 | 15 |
| 2022.10.11. 03:00 | 15 |
| 2022.10.11. 03:15 | 15 |
| 2022.10.11. 03:30 | 15 |
| 2022.10.11. 03:45 | 15 |
| 2022.10.11. 04:00 | 15 |
| 2022.10.11. 04:15 | 15 |
| 2022.10.11. 04:30 | 15 |
| 2022.10.11. 04:45 | 15 |
| 2022.10.11. 05:00 | 15 |
| 2022.10.11. 05:15 | 15 |
| 2022.10.11. 05:30 | 15 |
| 2022.10.11. 05:45 | 15 |
| 2022.10.11. 06:00 | 15 |
| 2022.10.11. 06:15 | 15 |
| 2022.10.11. 06:30 | 15 |
| 2022.10.11. 06:45 | 15 |
| 2022.10.11. 07:00 | 15 |
| 2022.10.11. 07:15 | 15 |
| 2022.10.11. 07:30 | 15 |
| 2022.10.11. 07:45 | 15 |
| 2022.10.11. 08:00 | 15 |
| 2022.10.11. 08:15 | 15 |
| 2022.10.11. 08:30 | 15 |
| 2022.10.11. 08:45 | 15 |
| 2022.10.11. 09:00 | 15 |
| 2022.10.11. 09:15 | 15 |
| 2022.10.11. 09:30 | 15 |
| 2022.10.11. 09:45 | 15 |
| 2022.10.11. 10:00 | 15 |
| 2022.10.11. 10:15 | 15 |
| 2022.10.11. 10:30 | 15 |
| 2022.10.11. 10:45 | 15 |
| 2022.10.11. 11:00 | 15 |
| 2022.10.11. 11:15 | 15 |
| 2022.10.11. 11:30 | 15 |
| 2022.10.11. 11:45 | 15 |
| 2022.10.11. 12:00 | 15 |
| 2022.10.11. 12:15 | 15 |
| 2022.10.11. 12:30 | 15 |
| 2022.10.11. 12:45 | 15 |
| 2022.10.11. 13:00 | 15 |
| 2022.10.11. 13:15 | 15 |
| 2022.10.11. 13:30 | 15 |
| 2022.10.11. 13:45 | 15 |
| 2022.10.11. 14:00 | 15 |
| 2022.10.11. 14:15 | 15 |
| 2022.10.11. 14:30 | 15 |
| 2022.10.11. 14:45 | 15 |
| 2022.10.11. 15:00 | 15 |
| 2022.10.11. 15:15 | 15 |
| 2022.10.11. 15:30 | 15 |
| 2022.10.11. 15:45 | 15 |
| 2022.10.11. 16:00 | 15 |
| 2022.10.11. 16:15 | 15 |
| 2022.10.11. 16:30 | 15 |
| 2022.10.11. 16:45 | 15 |
| 2022.10.11. 17:00 | 15 |
| 2022.10.11. 17:15 | 15 |
| 2022.10.11. 17:30 | 15 |
| 2022.10.11. 17:45 | 15 |
| 2022.10.11. 18:00 | 15 |
| 2022.10.11. 18:15 | 15 |
| 2022.10.11. 18:30 | 15 |
| 2022.10.11. 18:45 | 15 |
| 2022.10.11. 19:00 | 15 |
| 2022.10.11. 19:15 | 15 |
| 2022.10.11. 19:30 | 15 |
| 2022.10.11. 19:45 | 15 |
| 2022.10.11. 20:00 | 15 |
| 2022.10.11. 20:15 | 15 |
| 2022.10.11. 20:30 | 15 |
| 2022.10.11. 20:45 | 15 |
| 2022.10.11. 21:00 | 15 |
| 2022.10.11. 21:15 | 15 |
| 2022.10.11. 21:30 | 15 |
| 2022.10.11. 21:45 | 15 |
| 2022.10.11. 22:00 | 15 |
| 2022.10.11. 22:15 | 15 |
| 2022.10.11. 22:30 | 15 |
| 2022.10.11. 22:45 | 15 |
| 2022.10.11. 23:00 | 15 |
| 2022.10.11. 23:15 | 15 |
| 2022.10.11. 23:30 | 15 |
| 2022.10.11. 23:45 | 15 |
| 2022.10.12. 00:00 | 15 |
| 2022.10.12. 00:15 | 15 |
| 2022.10.12. 00:30 | 15 |
| 2022.10.12. 00:45 | 15 |
| 2022.10.12. 01:00 | 15 |
| 2022.10.12. 01:15 | 15 |
| 2022.10.12. 01:30 | 15 |
| 2022.10.12. 01:45 | 15 |
| 2022.10.12. 02:00 | 15 |
| 2022.10.12. 02:15 | 15 |
| 2022.10.12. 02:30 | 15 |
| 2022.10.12. 02:45 | 15 |
| 2022.10.12. 03:00 | 15 |
| 2022.10.12. 03:15 | 15 |
| 2022.10.12. 03:30 | 15 |
| 2022.10.12. 03:45 | 15 |
| 2022.10.12. 04:00 | 15 |
| 2022.10.12. 04:15 | 15 |
| 2022.10.12. 04:30 | 15 |
| 2022.10.12. 04:45 | 15 |
| 2022.10.12. 05:00 | 15 |
| 2022.10.12. 05:15 | 15 |
| 2022.10.12. 05:30 | 15 |
| 2022.10.12. 05:45 | 15 |
| 2022.10.12. 06:00 | 15 |
| 2022.10.12. 06:15 | 15 |
| 2022.10.12. 06:30 | 15 |
| 2022.10.12. 06:45 | 15 |
| 2022.10.12. 07:00 | 15 |
| 2022.10.12. 07:15 | 15 |
| 2022.10.12. 07:30 | 15 |
| 2022.10.12. 07:45 | 15 |
| 2022.10.12. 08:00 | 15 |
| 2022.10.12. 08:15 | 15 |
| 2022.10.12. 08:30 | 15 |
| 2022.10.12. 08:45 | 15 |
| 2022.10.12. 09:00 | 15 |
| 2022.10.12. 09:15 | 15 |
| 2022.10.12. 09:30 | 15 |
| 2022.10.12. 09:45 | 15 |
| 2022.10.12. 10:00 | 15 |
| 2022.10.12. 10:15 | 15 |
| 2022.10.12. 10:30 | 15 |
| 2022.10.12. 10:45 | 15 |
| 2022.10.12. 11:00 | 15 |
| 2022.10.12. 11:15 | 15 |
| 2022.10.12. 11:30 | 15 |
| 2022.10.12. 11:45 | 15 |
| 2022.10.12. 12:00 | 15 |
| 2022.10.12. 12:15 | 15 |
| 2022.10.12. 12:30 | 15 |
| 2022.10.12. 12:45 | 15 |
| 2022.10.12. 13:00 | 15 |
| 2022.10.12. 13:15 | 15 |
| 2022.10.12. 13:30 | 15 |
| 2022.10.12. 13:45 | 15 |
| 2022.10.12. 14:00 | 15 |
| 2022.10.12. 14:15 | 15 |
| 2022.10.12. 14:30 | 15 |
| 2022.10.12. 14:45 | 15 |
| 2022.10.12. 15:00 | 15 |
| 2022.10.12. 15:15 | 15 |
| 2022.10.12. 15:30 | 15 |
| 2022.10.12. 15:45 | 15 |
| 2022.10.12. 16:00 | 15 |
| 2022.10.12. 16:15 | 15 |
| 2022.10.12. 16:30 | 15 |
| 2022.10.12. 16:45 | 15 |
| 2022.10.12. 17:00 | 15 |
| 2022.10.12. 17:15 | 15 |
| 2022.10.12. 17:30 | 15 |
| 2022.10.12. 17:45 | 15 |
| 2022.10.12. 18:00 | 15 |
| 2022.10.12. 18:15 | 15 |
| 2022.10.12. 18:30 | 15 |
| 2022.10.12. 18:45 | 15 |
| 2022.10.12. 19:00 | 15 |
| 2022.10.12. 19:15 | 15 |
| 2022.10.12. 19:30 | 15 |
| 2022.10.12. 19:45 | 15 |
| 2022.10.12. 20:00 | 15 |
| 2022.10.12. 20:15 | 15 |
| 2022.10.12. 20:30 | 15 |
| 2022.10.12. 20:45 | 15 |
| 2022.10.12. 21:00 | 15 |
| 2022.10.12. 21:15 | 15 |
| 2022.10.12. 21:30 | 15 |
| 2022.10.12. 21:45 | 15 |
| 2022.10.12. 22:00 | 15 |
| 2022.10.12. 22:15 | 15 |
| 2022.10.12. 22:30 | 15 |
| 2022.10.12. 22:45 | 15 |
| 2022.10.12. 23:00 | 15 |
| 2022.10.12. 23:15 | 15 |
| 2022.10.12. 23:30 | 15 |
| 2022.10.12. 23:45 | 15 |
| 2022.10.13. 00:00 | 15 |
| 2022.10.13. 00:15 | 15 |
| 2022.10.13. 00:30 | 15 |
| 2022.10.13. 00:45 | 15 |
| 2022.10.13. 01:00 | 15 |
| 2022.10.13. 01:15 | 15 |
| 2022.10.13. 01:30 | 15 |
| 2022.10.13. 01:45 | 15 |
| 2022.10.13. 02:00 | 15 |
| 2022.10.13. 02:15 | 15 |
| 2022.10.13. 02:30 | 15 |
| 2022.10.13. 02:45 | 15 |
| 2022.10.13. 03:00 | 15 |
| 2022.10.13. 03:15 | 15 |
| 2022.10.13. 03:30 | 15 |
| 2022.10.13. 03:45 | 15 |
| 2022.10.13. 04:00 | 15 |
| 2022.10.13. 04:15 | 15 |
| 2022.10.13. 04:30 | 15 |
| 2022.10.13. 04:45 | 15 |
| 2022.10.13. 05:00 | 15 |
| 2022.10.13. 05:15 | 15 |
| 2022.10.13. 05:30 | 15 |
| 2022.10.13. 05:45 | 15 |
| 2022.10.13. 06:00 | 15 |
| 2022.10.13. 06:15 | 15 |
| 2022.10.13. 06:30 | 15 |
| 2022.10.13. 06:45 | 15 |
| 2022.10.13. 07:00 | 15 |
| 2022.10.13. 07:15 | 15 |
| 2022.10.13. 07:30 | 15 |
| 2022.10.13. 07:45 | 15 |
| 2022.10.13. 08:00 | 15 |
| 2022.10.13. 08:15 | 15 |
| 2022.10.13. 08:30 | 15 |
| 2022.10.13. 08:45 | 15 |
| 2022.10.13. 09:00 | 15 |
| 2022.10.13. 09:15 | 15 |
| 2022.10.13. 09:30 | 15 |
| 2022.10.13. 09:45 | 15 |
| 2022.10.13. 10:00 | 15 |
| 2022.10.13. 10:15 | 15 |
| 2022.10.13. 10:30 | 15 |
| 2022.10.13. 10:45 | 15 |
| 2022.10.13. 11:00 | 15 |
| 2022.10.13. 11:15 | 15 |
| 2022.10.13. 11:30 | 15 |
| 2022.10.13. 11:45 | 15 |
| 2022.10.13. 12:00 | 15 |
| 2022.10.13. 12:15 | 15 |
| 2022.10.13. 12:30 | 15 |
| 2022.10.13. 12:45 | 15 |
| 2022.10.13. 13:00 | 15 |
| 2022.10.13. 13:15 | 15 |
| 2022.10.13. 13:30 | 15 |
| 2022.10.13. 13:45 | 15 |
| 2022.10.13. 14:00 | 15 |
| 2022.10.13. 14:15 | 15 |
| 2022.10.13. 14:30 | 15 |
| 2022.10.13. 14:45 | 15 |
| 2022.10.13. 15:00 | 15 |
| 2022.10.13. 15:15 | 15 |
| 2022.10.13. 15:30 | 15 |
| 2022.10.13. 15:45 | 15 |
| 2022.10.13. 16:00 | 15 |
| 2022.10.13. 16:15 | 15 |
| 2022.10.13. 16:30 | 15 |
| 2022.10.13. 16:45 | 15 |
| 2022.10.13. 17:00 | 15 |
| 2022.10.13. 17:15 | 15 |
| 2022.10.13. 17:30 | 15 |
| 2022.10.13. 17:45 | 15 |
| 2022.10.13. 18:00 | 15 |
| 2022.10.13. 18:15 | 15 |
| 2022.10.13. 18:30 | 15 |
| 2022.10.13. 18:45 | 15 |
| 2022.10.13. 19:00 | 15 |
| 2022.10.13. 19:15 | 15 |
| 2022.10.13. 19:30 | 15 |
| 2022.10.13. 19:45 | 15 |
| 2022.10.13. 20:00 | 15 |
| 2022.10.13. 20:15 | 15 |
| 2022.10.13. 20:30 | 15 |
| 2022.10.13. 20:45 | 15 |
| 2022.10.13. 21:00 | 15 |
| 2022.10.13. 21:15 | 15 |
| 2022.10.13. 21:30 | 15 |
| 2022.10.13. 21:45 | 15 |
| 2022.10.13. 22:00 | 15 |
| 2022.10.13. 22:15 | 15 |
| 2022.10.13. 22:30 | 15 |
| 2022.10.13. 22:45 | 15 |
| 2022.10.13. 23:00 | 15 |
| 2022.10.13. 23:15 | 15 |
| 2022.10.13. 23:30 | 15 |
| 2022.10.13. 23:45 | 15 |
| 2022.10.14. 00:00 | 15 |
| 2022.10.14. 00:15 | 15 |
| 2022.10.14. 00:30 | 15 |
| 2022.10.14. 00:45 | 15 |
| 2022.10.14. 01:00 | 15 |
| 2022.10.14. 01:15 | 15 |
| 2022.10.14. 01:30 | 15 |
| 2022.10.14. 01:45 | 15 |
| 2022.10.14. 02:00 | 15 |
| 2022.10.14. 02:15 | 15 |
| 2022.10.14. 02:30 | 15 |
| 2022.10.14. 02:45 | 15 |
| 2022.10.14. 03:00 | 15 |
| 2022.10.14. 03:15 | 15 |
| 2022.10.14. 03:30 | 15 |
| 2022.10.14. 03:45 | 15 |
| 2022.10.14. 04:00 | 15 |
| 2022.10.14. 04:15 | 15 |
| 2022.10.14. 04:30 | 15 |
| 2022.10.14. 04:45 | 15 |
| 2022.10.14. 05:00 | 15 |
| 2022.10.14. 05:15 | 15 |
| 2022.10.14. 05:30 | 15 |
| 2022.10.14. 05:45 | 15 |
| 2022.10.14. 06:00 | 15 |
| 2022.10.14. 06:15 | 15 |
| 2022.10.14. 06:30 | 15 |
| 2022.10.14. 06:45 | 15 |
| 2022.10.14. 07:00 | 15 |
| 2022.10.14. 07:15 | 15 |
| 2022.10.14. 07:30 | 15 |
| 2022.10.14. 07:45 | 15 |
| 2022.10.14. 08:00 | 15 |
| 2022.10.14. 08:15 | 15 |
| 2022.10.14. 08:30 | 15 |
| 2022.10.14. 08:45 | 15 |
| 2022.10.14. 09:00 | 15 |
| 2022.10.14. 09:15 | 15 |
| 2022.10.14. 09:30 | 15 |
| 2022.10.14. 09:45 | 15 |
| 2022.10.14. 10:00 | 15 |
| 2022.10.14. 10:15 | 15 |
| 2022.10.14. 10:30 | 15 |
| 2022.10.14. 10:45 | 15 |
| 2022.10.14. 11:00 | 15 |
| 2022.10.14. 11:15 | 15 |
| 2022.10.14. 11:30 | 15 |
| 2022.10.14. 11:45 | 15 |
| 2022.10.14. 12:00 | 15 |
| 2022.10.14. 12:15 | 15 |
| 2022.10.14. 12:30 | 15 |
| 2022.10.14. 12:45 | 15 |
| 2022.10.14. 13:00 | 15 |
| 2022.10.14. 13:15 | 15 |
| 2022.10.14. 13:30 | 15 |
| 2022.10.14. 13:45 | 15 |
| 2022.10.14. 14:00 | 15 |
| 2022.10.14. 14:15 | 15 |
| 2022.10.14. 14:30 | 15 |
| 2022.10.14. 14:45 | 15 |
| 2022.10.14. 15:00 | 15 |
| 2022.10.14. 15:15 | 15 |
| 2022.10.14. 15:30 | 15 |
| 2022.10.14. 15:45 | 15 |
| 2022.10.14. 16:00 | 15 |
| 2022.10.14. 16:15 | 15 |
| 2022.10.14. 16:30 | 15 |
| 2022.10.14. 16:45 | 15 |
| 2022.10.14. 17:00 | 15 |
| 2022.10.14. 17:15 | 15 |
| 2022.10.14. 17:30 | 15 |
| 2022.10.14. 17:45 | 15 |
| 2022.10.14. 18:00 | 15 |
| 2022.10.14. 18:15 | 15 |
| 2022.10.14. 18:30 | 15 |
| 2022.10.14. 18:45 | 15 |
| 2022.10.14. 19:00 | 15 |
| 2022.10.14. 19:15 | 15 |
| 2022.10.14. 19:30 | 15 |
| 2022.10.14. 19:45 | 15 |
| 2022.10.14. 20:00 | 15 |
| 2022.10.14. 20:15 | 15 |
| 2022.10.14. 20:30 | 15 |
| 2022.10.14. 20:45 | 15 |
| 2022.10.14. 21:00 | 15 |
| 2022.10.14. 21:15 | 15 |
| 2022.10.14. 21:30 | 15 |
| 2022.10.14. 21:45 | 15 |
| 2022.10.14. 22:00 | 15 |
| 2022.10.14. 22:15 | 15 |
| 2022.10.14. 22:30 | 15 |
| 2022.10.14. 22:45 | 15 |
| 2022.10.14. 23:00 | 15 |
| 2022.10.14. 23:15 | 15 |
| 2022.10.14. 23:30 | 15 |
| 2022.10.14. 23:45 | 15 |
| 2022.10.15. 00:00 | 13 |
| 2022.10.15. 00:15 | 13 |
| 2022.10.15. 00:30 | 13 |
| 2022.10.15. 00:45 | 13 |
| 2022.10.15. 01:00 | 13 |
| 2022.10.15. 01:15 | 13 |
| 2022.10.15. 01:30 | 13 |
| 2022.10.15. 01:45 | 13 |
| 2022.10.15. 02:00 | 13 |
| 2022.10.15. 02:15 | 13 |
| 2022.10.15. 02:30 | 13 |
| 2022.10.15. 02:45 | 13 |
| 2022.10.15. 03:00 | 13 |
| 2022.10.15. 03:15 | 13 |
| 2022.10.15. 03:30 | 13 |
| 2022.10.15. 03:45 | 13 |
| 2022.10.15. 04:00 | 13 |
| 2022.10.15. 04:15 | 13 |
| 2022.10.15. 04:30 | 13 |
| 2022.10.15. 04:45 | 13 |
| 2022.10.15. 05:00 | 13 |
| 2022.10.15. 05:15 | 13 |
| 2022.10.15. 05:30 | 13 |
| 2022.10.15. 05:45 | 13 |
| 2022.10.15. 06:00 | 13 |
| 2022.10.15. 06:15 | 13 |
| 2022.10.15. 06:30 | 13 |
| 2022.10.15. 06:45 | 13 |
| 2022.10.15. 07:00 | 13 |
| 2022.10.15. 07:15 | 13 |
| 2022.10.15. 07:30 | 13 |
| 2022.10.15. 07:45 | 13 |
| 2022.10.15. 08:00 | 13 |
| 2022.10.15. 08:15 | 13 |
| 2022.10.15. 08:30 | 13 |
| 2022.10.15. 08:45 | 13 |
| 2022.10.15. 09:00 | 13 |
| 2022.10.15. 09:15 | 13 |
| 2022.10.15. 09:30 | 13 |
| 2022.10.15. 09:45 | 13 |
| 2022.10.15. 10:00 | 13 |
| 2022.10.15. 10:15 | 13 |
| 2022.10.15. 10:30 | 13 |
| 2022.10.15. 10:45 | 13 |
| 2022.10.15. 11:00 | 13 |
| 2022.10.15. 11:15 | 13 |
| 2022.10.15. 11:30 | 13 |
| 2022.10.15. 11:45 | 13 |
| 2022.10.15. 12:00 | 13 |
| 2022.10.15. 12:15 | 13 |
| 2022.10.15. 12:30 | 13 |
| 2022.10.15. 12:45 | 13 |
| 2022.10.15. 13:00 | 13 |
| 2022.10.15. 13:15 | 13 |
| 2022.10.15. 13:30 | 13 |
| 2022.10.15. 13:45 | 13 |
| 2022.10.15. 14:00 | 13 |
| 2022.10.15. 14:15 | 13 |
| 2022.10.15. 14:30 | 13 |
| 2022.10.15. 14:45 | 13 |
| 2022.10.15. 15:00 | 13 |
| 2022.10.15. 15:15 | 13 |
| 2022.10.15. 15:30 | 13 |
| 2022.10.15. 15:45 | 13 |
| 2022.10.15. 16:00 | 13 |
| 2022.10.15. 16:15 | 13 |
| 2022.10.15. 16:30 | 13 |
| 2022.10.15. 16:45 | 13 |
| 2022.10.15. 17:00 | 13 |
| 2022.10.15. 17:15 | 13 |
| 2022.10.15. 17:30 | 13 |
| 2022.10.15. 17:45 | 13 |
| 2022.10.15. 18:00 | 13 |
| 2022.10.15. 18:15 | 13 |
| 2022.10.15. 18:30 | 13 |
| 2022.10.15. 18:45 | 13 |
| 2022.10.15. 19:00 | 13 |
| 2022.10.15. 19:15 | 13 |
| 2022.10.15. 19:30 | 13 |
| 2022.10.15. 19:45 | 13 |
| 2022.10.15. 20:00 | 13 |
| 2022.10.15. 20:15 | 13 |
| 2022.10.15. 20:30 | 13 |
| 2022.10.15. 20:45 | 13 |
| 2022.10.15. 21:00 | 13 |
| 2022.10.15. 21:15 | 13 |
| 2022.10.15. 21:30 | 13 |
| 2022.10.15. 21:45 | 13 |
| 2022.10.15. 22:00 | 13 |
| 2022.10.15. 22:15 | 13 |
| 2022.10.15. 22:30 | 13 |
| 2022.10.15. 22:45 | 13 |
| 2022.10.15. 23:00 | 13 |
| 2022.10.15. 23:15 | 13 |
| 2022.10.15. 23:30 | 13 |
| 2022.10.15. 23:45 | 13 |
| 2022.10.16. 00:00 | 13 |
| 2022.10.16. 00:15 | 13 |
| 2022.10.16. 00:30 | 13 |
| 2022.10.16. 00:45 | 13 |
| 2022.10.16. 01:00 | 13 |
| 2022.10.16. 01:15 | 13 |
| 2022.10.16. 01:30 | 13 |
| 2022.10.16. 01:45 | 13 |
| 2022.10.16. 02:00 | 13 |
| 2022.10.16. 02:15 | 13 |
| 2022.10.16. 02:30 | 13 |
| 2022.10.16. 02:45 | 13 |
| 2022.10.16. 03:00 | 13 |
| 2022.10.16. 03:15 | 13 |
| 2022.10.16. 03:30 | 13 |
| 2022.10.16. 03:45 | 13 |
| 2022.10.16. 04:00 | 13 |
| 2022.10.16. 04:15 | 13 |
| 2022.10.16. 04:30 | 13 |
| 2022.10.16. 04:45 | 13 |
| 2022.10.16. 05:00 | 13 |
| 2022.10.16. 05:15 | 13 |
| 2022.10.16. 05:30 | 13 |
| 2022.10.16. 05:45 | 13 |
| 2022.10.16. 06:00 | 13 |
| 2022.10.16. 06:15 | 13 |
| 2022.10.16. 06:30 | 13 |
| 2022.10.16. 06:45 | 13 |
| 2022.10.16. 07:00 | 13 |
| 2022.10.16. 07:15 | 13 |
| 2022.10.16. 07:30 | 13 |
| 2022.10.16. 07:45 | 13 |
| 2022.10.16. 08:00 | 13 |
| 2022.10.16. 08:15 | 13 |
| 2022.10.16. 08:30 | 13 |
| 2022.10.16. 08:45 | 13 |
| 2022.10.16. 09:00 | 13 |
| 2022.10.16. 09:15 | 13 |
| 2022.10.16. 09:30 | 13 |
| 2022.10.16. 09:45 | 13 |
| 2022.10.16. 10:00 | 13 |
| 2022.10.16. 10:15 | 13 |
| 2022.10.16. 10:30 | 13 |
| 2022.10.16. 10:45 | 13 |
| 2022.10.16. 11:00 | 13 |
| 2022.10.16. 11:15 | 13 |
| 2022.10.16. 11:30 | 13 |
| 2022.10.16. 11:45 | 13 |
| 2022.10.16. 12:00 | 13 |
| 2022.10.16. 12:15 | 13 |
| 2022.10.16. 12:30 | 13 |
| 2022.10.16. 12:45 | 13 |
| 2022.10.16. 13:00 | 13 |
| 2022.10.16. 13:15 | 13 |
| 2022.10.16. 13:30 | 13 |
| 2022.10.16. 13:45 | 13 |
| 2022.10.16. 14:00 | 13 |
| 2022.10.16. 14:15 | 13 |
| 2022.10.16. 14:30 | 13 |
| 2022.10.16. 14:45 | 13 |
| 2022.10.16. 15:00 | 13 |
| 2022.10.16. 15:15 | 13 |
| 2022.10.16. 15:30 | 13 |
| 2022.10.16. 15:45 | 13 |
| 2022.10.16. 16:00 | 13 |
| 2022.10.16. 16:15 | 13 |
| 2022.10.16. 16:30 | 13 |
| 2022.10.16. 16:45 | 13 |
| 2022.10.16. 17:00 | 13 |
| 2022.10.16. 17:15 | 13 |
| 2022.10.16. 17:30 | 13 |
| 2022.10.16. 17:45 | 13 |
| 2022.10.16. 18:00 | 13 |
| 2022.10.16. 18:15 | 13 |
| 2022.10.16. 18:30 | 13 |
| 2022.10.16. 18:45 | 13 |
| 2022.10.16. 19:00 | 13 |
| 2022.10.16. 19:15 | 13 |
| 2022.10.16. 19:30 | 13 |
| 2022.10.16. 19:45 | 13 |
| 2022.10.16. 20:00 | 13 |
| 2022.10.16. 20:15 | 13 |
| 2022.10.16. 20:30 | 13 |
| 2022.10.16. 20:45 | 13 |
| 2022.10.16. 21:00 | 13 |
| 2022.10.16. 21:15 | 13 |
| 2022.10.16. 21:30 | 13 |
| 2022.10.16. 21:45 | 13 |
| 2022.10.16. 22:00 | 13 |
| 2022.10.16. 22:15 | 13 |
| 2022.10.16. 22:30 | 13 |
| 2022.10.16. 22:45 | 13 |
| 2022.10.16. 23:00 | 13 |
| 2022.10.16. 23:15 | 13 |
| 2022.10.16. 23:30 | 13 |
| 2022.10.16. 23:45 | 13 |
| 2022.10.17. 00:00 | 13 |
| 2022.10.17. 00:15 | 13 |
| 2022.10.17. 00:30 | 13 |
| 2022.10.17. 00:45 | 13 |
| 2022.10.17. 01:00 | 13 |
| 2022.10.17. 01:15 | 13 |
| 2022.10.17. 01:30 | 13 |
| 2022.10.17. 01:45 | 13 |
| 2022.10.17. 02:00 | 13 |
| 2022.10.17. 02:15 | 13 |
| 2022.10.17. 02:30 | 13 |
| 2022.10.17. 02:45 | 13 |
| 2022.10.17. 03:00 | 13 |
| 2022.10.17. 03:15 | 13 |
| 2022.10.17. 03:30 | 13 |
| 2022.10.17. 03:45 | 13 |
| 2022.10.17. 04:00 | 13 |
| 2022.10.17. 04:15 | 13 |
| 2022.10.17. 04:30 | 13 |
| 2022.10.17. 04:45 | 13 |
| 2022.10.17. 05:00 | 13 |
| 2022.10.17. 05:15 | 13 |
| 2022.10.17. 05:30 | 13 |
| 2022.10.17. 05:45 | 13 |
| 2022.10.17. 06:00 | 13 |
| 2022.10.17. 06:15 | 13 |
| 2022.10.17. 06:30 | 13 |
| 2022.10.17. 06:45 | 13 |
| 2022.10.17. 07:00 | 13 |
| 2022.10.17. 07:15 | 13 |
| 2022.10.17. 07:30 | 13 |
| 2022.10.17. 07:45 | 13 |
| 2022.10.17. 08:00 | 13 |
| 2022.10.17. 08:15 | 13 |
| 2022.10.17. 08:30 | 13 |
| 2022.10.17. 08:45 | 13 |
| 2022.10.17. 09:00 | 13 |
| 2022.10.17. 09:15 | 13 |
| 2022.10.17. 09:30 | 13 |
| 2022.10.17. 09:45 | 13 |
| 2022.10.17. 10:00 | 13 |
| 2022.10.17. 10:15 | 13 |
| 2022.10.17. 10:30 | 13 |
| 2022.10.17. 10:45 | 13 |
| 2022.10.17. 11:00 | 13 |
| 2022.10.17. 11:15 | 13 |
| 2022.10.17. 11:30 | 13 |
| 2022.10.17. 11:45 | 13 |
| 2022.10.17. 12:00 | 13 |
| 2022.10.17. 12:15 | 13 |
| 2022.10.17. 12:30 | 13 |
| 2022.10.17. 12:45 | 13 |
| 2022.10.17. 13:00 | 13 |
| 2022.10.17. 13:15 | 13 |
| 2022.10.17. 13:30 | 13 |
| 2022.10.17. 13:45 | 13 |
| 2022.10.17. 14:00 | 13 |
| 2022.10.17. 14:15 | 13 |
| 2022.10.17. 14:30 | 13 |
| 2022.10.17. 14:45 | 13 |
| 2022.10.17. 15:00 | 13 |
| 2022.10.17. 15:15 | 13 |
| 2022.10.17. 15:30 | 13 |
| 2022.10.17. 15:45 | 13 |
| 2022.10.17. 16:00 | 13 |
| 2022.10.17. 16:15 | 13 |
| 2022.10.17. 16:30 | 13 |
| 2022.10.17. 16:45 | 13 |
| 2022.10.17. 17:00 | 13 |
| 2022.10.17. 17:15 | 13 |
| 2022.10.17. 17:30 | 13 |
| 2022.10.17. 17:45 | 13 |
| 2022.10.17. 18:00 | 13 |
| 2022.10.17. 18:15 | 13 |
| 2022.10.17. 18:30 | 13 |
| 2022.10.17. 18:45 | 13 |
| 2022.10.17. 19:00 | 13 |
| 2022.10.17. 19:15 | 13 |
| 2022.10.17. 19:30 | 13 |
| 2022.10.17. 19:45 | 13 |
| 2022.10.17. 20:00 | 13 |
| 2022.10.17. 20:15 | 13 |
| 2022.10.17. 20:30 | 13 |
| 2022.10.17. 20:45 | 13 |
| 2022.10.17. 21:00 | 13 |
| 2022.10.17. 21:15 | 13 |
| 2022.10.17. 21:30 | 13 |
| 2022.10.17. 21:45 | 13 |
| 2022.10.17. 22:00 | 13 |
| 2022.10.17. 22:15 | 13 |
| 2022.10.17. 22:30 | 13 |
| 2022.10.17. 22:45 | 13 |
| 2022.10.17. 23:00 | 13 |
| 2022.10.17. 23:15 | 13 |
| 2022.10.17. 23:30 | 13 |
| 2022.10.17. 23:45 | 13 |
| 2022.10.18. 00:00 | 13 |
| 2022.10.18. 00:15 | 13 |
| 2022.10.18. 00:30 | 13 |
| 2022.10.18. 00:45 | 13 |
| 2022.10.18. 01:00 | 13 |
| 2022.10.18. 01:15 | 13 |
| 2022.10.18. 01:30 | 13 |
| 2022.10.18. 01:45 | 13 |
| 2022.10.18. 02:00 | 13 |
| 2022.10.18. 02:15 | 13 |
| 2022.10.18. 02:30 | 13 |
| 2022.10.18. 02:45 | 13 |
| 2022.10.18. 03:00 | 13 |
| 2022.10.18. 03:15 | 13 |
| 2022.10.18. 03:30 | 13 |
| 2022.10.18. 03:45 | 13 |
| 2022.10.18. 04:00 | 13 |
| 2022.10.18. 04:15 | 13 |
| 2022.10.18. 04:30 | 13 |
| 2022.10.18. 04:45 | 13 |
| 2022.10.18. 05:00 | 13 |
| 2022.10.18. 05:15 | 13 |
| 2022.10.18. 05:30 | 13 |
| 2022.10.18. 05:45 | 13 |
| 2022.10.18. 06:00 | 13 |
| 2022.10.18. 06:15 | 13 |
| 2022.10.18. 06:30 | 13 |
| 2022.10.18. 06:45 | 13 |
| 2022.10.18. 07:00 | 13 |
| 2022.10.18. 07:15 | 13 |
| 2022.10.18. 07:30 | 13 |
| 2022.10.18. 07:45 | 13 |
| 2022.10.18. 08:00 | 13 |
| 2022.10.18. 08:15 | 13 |
| 2022.10.18. 08:30 | 13 |
| 2022.10.18. 08:45 | 13 |
| 2022.10.18. 09:00 | 13 |
| 2022.10.18. 09:15 | 13 |
| 2022.10.18. 09:30 | 13 |
| 2022.10.18. 09:45 | 13 |
| 2022.10.18. 10:00 | 13 |
| 2022.10.18. 10:15 | 13 |
| 2022.10.18. 10:30 | 13 |
| 2022.10.18. 10:45 | 13 |
| 2022.10.18. 11:00 | 13 |
| 2022.10.18. 11:15 | 13 |
| 2022.10.18. 11:30 | 13 |
| 2022.10.18. 11:45 | 13 |
| 2022.10.18. 12:00 | 13 |
| 2022.10.18. 12:15 | 13 |
| 2022.10.18. 12:30 | 13 |
| 2022.10.18. 12:45 | 13 |
| 2022.10.18. 13:00 | 13 |
| 2022.10.18. 13:15 | 13 |
| 2022.10.18. 13:30 | 13 |
| 2022.10.18. 13:45 | 13 |
| 2022.10.18. 14:00 | 13 |
| 2022.10.18. 14:15 | 13 |
| 2022.10.18. 14:30 | 13 |
| 2022.10.18. 14:45 | 13 |
| 2022.10.18. 15:00 | 13 |
| 2022.10.18. 15:15 | 13 |
| 2022.10.18. 15:30 | 13 |
| 2022.10.18. 15:45 | 13 |
| 2022.10.18. 16:00 | 13 |
| 2022.10.18. 16:15 | 13 |
| 2022.10.18. 16:30 | 13 |
| 2022.10.18. 16:45 | 13 |
| 2022.10.18. 17:00 | 13 |
| 2022.10.18. 17:15 | 13 |
| 2022.10.18. 17:30 | 13 |
| 2022.10.18. 17:45 | 13 |
| 2022.10.18. 18:00 | 13 |
| 2022.10.18. 18:15 | 13 |
| 2022.10.18. 18:30 | 13 |
| 2022.10.18. 18:45 | 13 |
| 2022.10.18. 19:00 | 13 |
| 2022.10.18. 19:15 | 13 |
| 2022.10.18. 19:30 | 13 |
| 2022.10.18. 19:45 | 13 |
| 2022.10.18. 20:00 | 13 |
| 2022.10.18. 20:15 | 13 |
| 2022.10.18. 20:30 | 13 |
| 2022.10.18. 20:45 | 13 |
| 2022.10.18. 21:00 | 13 |
| 2022.10.18. 21:15 | 13 |
| 2022.10.18. 21:30 | 13 |
| 2022.10.18. 21:45 | 13 |
| 2022.10.18. 22:00 | 13 |
| 2022.10.18. 22:15 | 13 |
| 2022.10.18. 22:30 | 13 |
| 2022.10.18. 22:45 | 13 |
| 2022.10.18. 23:00 | 13 |
| 2022.10.18. 23:15 | 13 |
| 2022.10.18. 23:30 | 13 |
| 2022.10.18. 23:45 | 13 |
| 2022.10.19. 00:00 | 13 |
| 2022.10.19. 00:15 | 13 |
| 2022.10.19. 00:30 | 13 |
| 2022.10.19. 00:45 | 13 |
| 2022.10.19. 01:00 | 13 |
| 2022.10.19. 01:15 | 13 |
| 2022.10.19. 01:30 | 13 |
| 2022.10.19. 01:45 | 13 |
| 2022.10.19. 02:00 | 13 |
| 2022.10.19. 02:15 | 13 |
| 2022.10.19. 02:30 | 13 |
| 2022.10.19. 02:45 | 13 |
| 2022.10.19. 03:00 | 13 |
| 2022.10.19. 03:15 | 13 |
| 2022.10.19. 03:30 | 13 |
| 2022.10.19. 03:45 | 13 |
| 2022.10.19. 04:00 | 13 |
| 2022.10.19. 04:15 | 13 |
| 2022.10.19. 04:30 | 13 |
| 2022.10.19. 04:45 | 13 |
| 2022.10.19. 05:00 | 13 |
| 2022.10.19. 05:15 | 13 |
| 2022.10.19. 05:30 | 13 |
| 2022.10.19. 05:45 | 13 |
| 2022.10.19. 06:00 | 13 |
| 2022.10.19. 06:15 | 13 |
| 2022.10.19. 06:30 | 13 |
| 2022.10.19. 06:45 | 13 |
| 2022.10.19. 07:00 | 13 |
| 2022.10.19. 07:15 | 13 |
| 2022.10.19. 07:30 | 13 |
| 2022.10.19. 07:45 | 13 |
| 2022.10.19. 08:00 | 13 |
| 2022.10.19. 08:15 | 13 |
| 2022.10.19. 08:30 | 13 |
| 2022.10.19. 08:45 | 13 |
| 2022.10.19. 09:00 | 13 |
| 2022.10.19. 09:15 | 13 |
| 2022.10.19. 09:30 | 13 |
| 2022.10.19. 09:45 | 13 |
| 2022.10.19. 10:00 | 13 |
| 2022.10.19. 10:15 | 13 |
| 2022.10.19. 10:30 | 13 |
| 2022.10.19. 10:45 | 13 |
| 2022.10.19. 11:00 | 13 |
| 2022.10.19. 11:15 | 13 |
| 2022.10.19. 11:30 | 13 |
| 2022.10.19. 11:45 | 13 |
| 2022.10.19. 12:00 | 13 |
| 2022.10.19. 12:15 | 13 |
| 2022.10.19. 12:30 | 13 |
| 2022.10.19. 12:45 | 13 |
| 2022.10.19. 13:00 | 13 |
| 2022.10.19. 13:15 | 13 |
| 2022.10.19. 13:30 | 13 |
| 2022.10.19. 13:45 | 13 |
| 2022.10.19. 14:00 | 13 |
| 2022.10.19. 14:15 | 13 |
| 2022.10.19. 14:30 | 13 |
| 2022.10.19. 14:45 | 13 |
| 2022.10.19. 15:00 | 13 |
| 2022.10.19. 15:15 | 13 |
| 2022.10.19. 15:30 | 13 |
| 2022.10.19. 15:45 | 13 |
| 2022.10.19. 16:00 | 13 |
| 2022.10.19. 16:15 | 13 |
| 2022.10.19. 16:30 | 13 |
| 2022.10.19. 16:45 | 13 |
| 2022.10.19. 17:00 | 13 |
| 2022.10.19. 17:15 | 13 |
| 2022.10.19. 17:30 | 13 |
| 2022.10.19. 17:45 | 13 |
| 2022.10.19. 18:00 | 13 |
| 2022.10.19. 18:15 | 13 |
| 2022.10.19. 18:30 | 13 |
| 2022.10.19. 18:45 | 13 |
| 2022.10.19. 19:00 | 13 |
| 2022.10.19. 19:15 | 13 |
| 2022.10.19. 19:30 | 13 |
| 2022.10.19. 19:45 | 13 |
| 2022.10.19. 20:00 | 13 |
| 2022.10.19. 20:15 | 13 |
| 2022.10.19. 20:30 | 13 |
| 2022.10.19. 20:45 | 13 |
| 2022.10.19. 21:00 | 13 |
| 2022.10.19. 21:15 | 13 |
| 2022.10.19. 21:30 | 13 |
| 2022.10.19. 21:45 | 13 |
| 2022.10.19. 22:00 | 13 |
| 2022.10.19. 22:15 | 13 |
| 2022.10.19. 22:30 | 13 |
| 2022.10.19. 22:45 | 13 |
| 2022.10.19. 23:00 | 13 |
| 2022.10.19. 23:15 | 13 |
| 2022.10.19. 23:30 | 13 |
| 2022.10.19. 23:45 | 13 |
| 2022.10.20. 00:00 | 13 |
| 2022.10.20. 00:15 | 13 |
| 2022.10.20. 00:30 | 13 |
| 2022.10.20. 00:45 | 13 |
| 2022.10.20. 01:00 | 13 |
| 2022.10.20. 01:15 | 13 |
| 2022.10.20. 01:30 | 13 |
| 2022.10.20. 01:45 | 13 |
| 2022.10.20. 02:00 | 13 |
| 2022.10.20. 02:15 | 13 |
| 2022.10.20. 02:30 | 13 |
| 2022.10.20. 02:45 | 13 |
| 2022.10.20. 03:00 | 13 |
| 2022.10.20. 03:15 | 13 |
| 2022.10.20. 03:30 | 13 |
| 2022.10.20. 03:45 | 13 |
| 2022.10.20. 04:00 | 13 |
| 2022.10.20. 04:15 | 13 |
| 2022.10.20. 04:30 | 13 |
| 2022.10.20. 04:45 | 13 |
| 2022.10.20. 05:00 | 13 |
| 2022.10.20. 05:15 | 13 |
| 2022.10.20. 05:30 | 13 |
| 2022.10.20. 05:45 | 13 |
| 2022.10.20. 06:00 | 13 |
| 2022.10.20. 06:15 | 13 |
| 2022.10.20. 06:30 | 13 |
| 2022.10.20. 06:45 | 13 |
| 2022.10.20. 07:00 | 13 |
| 2022.10.20. 07:15 | 13 |
| 2022.10.20. 07:30 | 13 |
| 2022.10.20. 07:45 | 13 |
| 2022.10.20. 08:00 | 13 |
| 2022.10.20. 08:15 | 13 |
| 2022.10.20. 08:30 | 13 |
| 2022.10.20. 08:45 | 13 |
| 2022.10.20. 09:00 | 13 |
| 2022.10.20. 09:15 | 13 |
| 2022.10.20. 09:30 | 13 |
| 2022.10.20. 09:45 | 13 |
| 2022.10.20. 10:00 | 13 |
| 2022.10.20. 10:15 | 13 |
| 2022.10.20. 10:30 | 13 |
| 2022.10.20. 10:45 | 13 |
| 2022.10.20. 11:00 | 13 |
| 2022.10.20. 11:15 | 13 |
| 2022.10.20. 11:30 | 13 |
| 2022.10.20. 11:45 | 13 |
| 2022.10.20. 12:00 | 13 |
| 2022.10.20. 12:15 | 13 |
| 2022.10.20. 12:30 | 13 |
| 2022.10.20. 12:45 | 13 |
| 2022.10.20. 13:00 | 13 |
| 2022.10.20. 13:15 | 13 |
| 2022.10.20. 13:30 | 13 |
| 2022.10.20. 13:45 | 13 |
| 2022.10.20. 14:00 | 13 |
| 2022.10.20. 14:15 | 13 |
| 2022.10.20. 14:30 | 13 |
| 2022.10.20. 14:45 | 13 |
| 2022.10.20. 15:00 | 13 |
| 2022.10.20. 15:15 | 13 |
| 2022.10.20. 15:30 | 13 |
| 2022.10.20. 15:45 | 13 |
| 2022.10.20. 16:00 | 13 |
| 2022.10.20. 16:15 | 13 |
| 2022.10.20. 16:30 | 13 |
| 2022.10.20. 16:45 | 13 |
| 2022.10.20. 17:00 | 13 |
| 2022.10.20. 17:15 | 13 |
| 2022.10.20. 17:30 | 13 |
| 2022.10.20. 17:45 | 13 |
| 2022.10.20. 18:00 | 13 |
| 2022.10.20. 18:15 | 13 |
| 2022.10.20. 18:30 | 13 |
| 2022.10.20. 18:45 | 13 |
| 2022.10.20. 19:00 | 13 |
| 2022.10.20. 19:15 | 13 |
| 2022.10.20. 19:30 | 13 |
| 2022.10.20. 19:45 | 13 |
| 2022.10.20. 20:00 | 13 |
| 2022.10.20. 20:15 | 13 |
| 2022.10.20. 20:30 | 13 |
| 2022.10.20. 20:45 | 13 |
| 2022.10.20. 21:00 | 13 |
| 2022.10.20. 21:15 | 13 |
| 2022.10.20. 21:30 | 13 |
| 2022.10.20. 21:45 | 13 |
| 2022.10.20. 22:00 | 13 |
| 2022.10.20. 22:15 | 13 |
| 2022.10.20. 22:30 | 13 |
| 2022.10.20. 22:45 | 13 |
| 2022.10.20. 23:00 | 13 |
| 2022.10.20. 23:15 | 13 |
| 2022.10.20. 23:30 | 13 |
| 2022.10.20. 23:45 | 13 |
| 2022.10.21. 00:00 | 13 |
| 2022.10.21. 00:15 | 13 |
| 2022.10.21. 00:30 | 13 |
| 2022.10.21. 00:45 | 13 |
| 2022.10.21. 01:00 | 13 |
| 2022.10.21. 01:15 | 13 |
| 2022.10.21. 01:30 | 13 |
| 2022.10.21. 01:45 | 13 |
| 2022.10.21. 02:00 | 13 |
| 2022.10.21. 02:15 | 13 |
| 2022.10.21. 02:30 | 13 |
| 2022.10.21. 02:45 | 13 |
| 2022.10.21. 03:00 | 13 |
| 2022.10.21. 03:15 | 13 |
| 2022.10.21. 03:30 | 13 |
| 2022.10.21. 03:45 | 13 |
| 2022.10.21. 04:00 | 13 |
| 2022.10.21. 04:15 | 13 |
| 2022.10.21. 04:30 | 13 |
| 2022.10.21. 04:45 | 13 |
| 2022.10.21. 05:00 | 13 |
| 2022.10.21. 05:15 | 13 |
| 2022.10.21. 05:30 | 13 |
| 2022.10.21. 05:45 | 13 |
| 2022.10.21. 06:00 | 13 |
| 2022.10.21. 06:15 | 13 |
| 2022.10.21. 06:30 | 13 |
| 2022.10.21. 06:45 | 13 |
| 2022.10.21. 07:00 | 13 |
| 2022.10.21. 07:15 | 13 |
| 2022.10.21. 07:30 | 13 |
| 2022.10.21. 07:45 | 13 |
| 2022.10.21. 08:00 | 13 |
| 2022.10.21. 08:15 | 13 |
| 2022.10.21. 08:30 | 13 |
| 2022.10.21. 08:45 | 13 |
| 2022.10.21. 09:00 | 13 |
| 2022.10.21. 09:15 | 13 |
| 2022.10.21. 09:30 | 13 |
| 2022.10.21. 09:45 | 13 |
| 2022.10.21. 10:00 | 13 |
| 2022.10.21. 10:15 | 13 |
| 2022.10.21. 10:30 | 13 |
| 2022.10.21. 10:45 | 13 |
| 2022.10.21. 11:00 | 13 |
| 2022.10.21. 11:15 | 13 |
| 2022.10.21. 11:30 | 13 |
| 2022.10.21. 11:45 | 13 |
| 2022.10.21. 12:00 | 13 |
| 2022.10.21. 12:15 | 13 |
| 2022.10.21. 12:30 | 13 |
| 2022.10.21. 12:45 | 13 |
| 2022.10.21. 13:00 | 13 |
| 2022.10.21. 13:15 | 13 |
| 2022.10.21. 13:30 | 13 |
| 2022.10.21. 13:45 | 13 |
| 2022.10.21. 14:00 | 13 |
| 2022.10.21. 14:15 | 13 |
| 2022.10.21. 14:30 | 13 |
| 2022.10.21. 14:45 | 13 |
| 2022.10.21. 15:00 | 13 |
| 2022.10.21. 15:15 | 13 |
| 2022.10.21. 15:30 | 13 |
| 2022.10.21. 15:45 | 13 |
| 2022.10.21. 16:00 | 13 |
| 2022.10.21. 16:15 | 13 |
| 2022.10.21. 16:30 | 13 |
| 2022.10.21. 16:45 | 13 |
| 2022.10.21. 17:00 | 13 |
| 2022.10.21. 17:15 | 13 |
| 2022.10.21. 17:30 | 13 |
| 2022.10.21. 17:45 | 13 |
| 2022.10.21. 18:00 | 13 |
| 2022.10.21. 18:15 | 13 |
| 2022.10.21. 18:30 | 13 |
| 2022.10.21. 18:45 | 13 |
| 2022.10.21. 19:00 | 13 |
| 2022.10.21. 19:15 | 13 |
| 2022.10.21. 19:30 | 13 |
| 2022.10.21. 19:45 | 13 |
| 2022.10.21. 20:00 | 13 |
| 2022.10.21. 20:15 | 13 |
| 2022.10.21. 20:30 | 13 |
| 2022.10.21. 20:45 | 13 |
| 2022.10.21. 21:00 | 13 |
| 2022.10.21. 21:15 | 13 |
| 2022.10.21. 21:30 | 13 |
| 2022.10.21. 21:45 | 13 |
| 2022.10.21. 22:00 | 13 |
| 2022.10.21. 22:15 | 13 |
| 2022.10.21. 22:30 | 13 |
| 2022.10.21. 22:45 | 13 |
| 2022.10.21. 23:00 | 13 |
| 2022.10.21. 23:15 | 13 |
| 2022.10.21. 23:30 | 13 |
| 2022.10.21. 23:45 | 13 |
| 2022.10.22. 00:00 | 13 |
| 2022.10.22. 00:15 | 13 |
| 2022.10.22. 00:30 | 13 |
| 2022.10.22. 00:45 | 13 |
| 2022.10.22. 01:00 | 13 |
| 2022.10.22. 01:15 | 13 |
| 2022.10.22. 01:30 | 13 |
| 2022.10.22. 01:45 | 13 |
| 2022.10.22. 02:00 | 13 |
| 2022.10.22. 02:15 | 13 |
| 2022.10.22. 02:30 | 13 |
| 2022.10.22. 02:45 | 13 |
| 2022.10.22. 03:00 | 13 |
| 2022.10.22. 03:15 | 13 |
| 2022.10.22. 03:30 | 13 |
| 2022.10.22. 03:45 | 13 |
| 2022.10.22. 04:00 | 13 |
| 2022.10.22. 04:15 | 13 |
| 2022.10.22. 04:30 | 13 |
| 2022.10.22. 04:45 | 13 |
| 2022.10.22. 05:00 | 13 |
| 2022.10.22. 05:15 | 13 |
| 2022.10.22. 05:30 | 13 |
| 2022.10.22. 05:45 | 13 |
| 2022.10.22. 06:00 | 13 |
| 2022.10.22. 06:15 | 13 |
| 2022.10.22. 06:30 | 13 |
| 2022.10.22. 06:45 | 13 |
| 2022.10.22. 07:00 | 13 |
| 2022.10.22. 07:15 | 13 |
| 2022.10.22. 07:30 | 13 |
| 2022.10.22. 07:45 | 13 |
| 2022.10.22. 08:00 | 13 |
| 2022.10.22. 08:15 | 13 |
| 2022.10.22. 08:30 | 13 |
| 2022.10.22. 08:45 | 13 |
| 2022.10.22. 09:00 | 13 |
| 2022.10.22. 09:15 | 13 |
| 2022.10.22. 09:30 | 13 |
| 2022.10.22. 09:45 | 13 |
| 2022.10.22. 10:00 | 13 |
| 2022.10.22. 10:15 | 13 |
| 2022.10.22. 10:30 | 13 |
| 2022.10.22. 10:45 | 13 |
| 2022.10.22. 11:00 | 13 |
| 2022.10.22. 11:15 | 13 |
| 2022.10.22. 11:30 | 13 |
| 2022.10.22. 11:45 | 13 |
| 2022.10.22. 12:00 | 13 |
| 2022.10.22. 12:15 | 13 |
| 2022.10.22. 12:30 | 13 |
| 2022.10.22. 12:45 | 13 |
| 2022.10.22. 13:00 | 13 |
| 2022.10.22. 13:15 | 13 |
| 2022.10.22. 13:30 | 13 |
| 2022.10.22. 13:45 | 13 |
| 2022.10.22. 14:00 | 13 |
| 2022.10.22. 14:15 | 13 |
| 2022.10.22. 14:30 | 13 |
| 2022.10.22. 14:45 | 13 |
| 2022.10.22. 15:00 | 13 |
| 2022.10.22. 15:15 | 13 |
| 2022.10.22. 15:30 | 13 |
| 2022.10.22. 15:45 | 13 |
| 2022.10.22. 16:00 | 13 |
| 2022.10.22. 16:15 | 13 |
| 2022.10.22. 16:30 | 13 |
| 2022.10.22. 16:45 | 13 |
| 2022.10.22. 17:00 | 13 |
| 2022.10.22. 17:15 | 13 |
| 2022.10.22. 17:30 | 13 |
| 2022.10.22. 17:45 | 13 |
| 2022.10.22. 18:00 | 13 |
| 2022.10.22. 18:15 | 13 |
| 2022.10.22. 18:30 | 13 |
| 2022.10.22. 18:45 | 13 |
| 2022.10.22. 19:00 | 13 |
| 2022.10.22. 19:15 | 13 |
| 2022.10.22. 19:30 | 13 |
| 2022.10.22. 19:45 | 13 |
| 2022.10.22. 20:00 | 13 |
| 2022.10.22. 20:15 | 13 |
| 2022.10.22. 20:30 | 13 |
| 2022.10.22. 20:45 | 13 |
| 2022.10.22. 21:00 | 13 |
| 2022.10.22. 21:15 | 13 |
| 2022.10.22. 21:30 | 13 |
| 2022.10.22. 21:45 | 13 |
| 2022.10.22. 22:00 | 13 |
| 2022.10.22. 22:15 | 13 |
| 2022.10.22. 22:30 | 13 |
| 2022.10.22. 22:45 | 13 |
| 2022.10.22. 23:00 | 13 |
| 2022.10.22. 23:15 | 13 |
| 2022.10.22. 23:30 | 13 |
| 2022.10.22. 23:45 | 13 |
| 2022.10.23. 00:00 | 13 |
| 2022.10.23. 00:15 | 13 |
| 2022.10.23. 00:30 | 13 |
| 2022.10.23. 00:45 | 13 |
| 2022.10.23. 01:00 | 13 |
| 2022.10.23. 01:15 | 13 |
| 2022.10.23. 01:30 | 13 |
| 2022.10.23. 01:45 | 13 |
| 2022.10.23. 02:00 | 13 |
| 2022.10.23. 02:15 | 13 |
| 2022.10.23. 02:30 | 13 |
| 2022.10.23. 02:45 | 13 |
| 2022.10.23. 03:00 | 13 |
| 2022.10.23. 03:15 | 13 |
| 2022.10.23. 03:30 | 13 |
| 2022.10.23. 03:45 | 13 |
| 2022.10.23. 04:00 | 13 |
| 2022.10.23. 04:15 | 13 |
| 2022.10.23. 04:30 | 13 |
| 2022.10.23. 04:45 | 13 |
| 2022.10.23. 05:00 | 13 |
| 2022.10.23. 05:15 | 13 |
| 2022.10.23. 05:30 | 13 |
| 2022.10.23. 05:45 | 13 |
| 2022.10.23. 06:00 | 13 |
| 2022.10.23. 06:15 | 13 |
| 2022.10.23. 06:30 | 13 |
| 2022.10.23. 06:45 | 13 |
| 2022.10.23. 07:00 | 13 |
| 2022.10.23. 07:15 | 13 |
| 2022.10.23. 07:30 | 13 |
| 2022.10.23. 07:45 | 13 |
| 2022.10.23. 08:00 | 13 |
| 2022.10.23. 08:15 | 13 |
| 2022.10.23. 08:30 | 13 |
| 2022.10.23. 08:45 | 13 |
| 2022.10.23. 09:00 | 13 |
| 2022.10.23. 09:15 | 13 |
| 2022.10.23. 09:30 | 13 |
| 2022.10.23. 09:45 | 13 |
| 2022.10.23. 10:00 | 13 |
| 2022.10.23. 10:15 | 13 |
| 2022.10.23. 10:30 | 13 |
| 2022.10.23. 10:45 | 13 |
| 2022.10.23. 11:00 | 13 |
| 2022.10.23. 11:15 | 13 |
| 2022.10.23. 11:30 | 13 |
| 2022.10.23. 11:45 | 13 |
| 2022.10.23. 12:00 | 13 |
| 2022.10.23. 12:15 | 13 |
| 2022.10.23. 12:30 | 13 |
| 2022.10.23. 12:45 | 13 |
| 2022.10.23. 13:00 | 13 |
| 2022.10.23. 13:15 | 13 |
| 2022.10.23. 13:30 | 13 |
| 2022.10.23. 13:45 | 13 |
| 2022.10.23. 14:00 | 13 |
| 2022.10.23. 14:15 | 13 |
| 2022.10.23. 14:30 | 13 |
| 2022.10.23. 14:45 | 13 |
| 2022.10.23. 15:00 | 13 |
| 2022.10.23. 15:15 | 13 |
| 2022.10.23. 15:30 | 13 |
| 2022.10.23. 15:45 | 13 |
| 2022.10.23. 16:00 | 13 |
| 2022.10.23. 16:15 | 13 |
| 2022.10.23. 16:30 | 13 |
| 2022.10.23. 16:45 | 13 |
| 2022.10.23. 17:00 | 13 |
| 2022.10.23. 17:15 | 13 |
| 2022.10.23. 17:30 | 13 |
| 2022.10.23. 17:45 | 13 |
| 2022.10.23. 18:00 | 13 |
| 2022.10.23. 18:15 | 13 |
| 2022.10.23. 18:30 | 13 |
| 2022.10.23. 18:45 | 13 |
| 2022.10.23. 19:00 | 13 |
| 2022.10.23. 19:15 | 13 |
| 2022.10.23. 19:30 | 13 |
| 2022.10.23. 19:45 | 13 |
| 2022.10.23. 20:00 | 13 |
| 2022.10.23. 20:15 | 13 |
| 2022.10.23. 20:30 | 13 |
| 2022.10.23. 20:45 | 13 |
| 2022.10.23. 21:00 | 13 |
| 2022.10.23. 21:15 | 13 |
| 2022.10.23. 21:30 | 13 |
| 2022.10.23. 21:45 | 13 |
| 2022.10.23. 22:00 | 13 |
| 2022.10.23. 22:15 | 13 |
| 2022.10.23. 22:30 | 13 |
| 2022.10.23. 22:45 | 13 |
| 2022.10.23. 23:00 | 13 |
| 2022.10.23. 23:15 | 13 |
| 2022.10.23. 23:30 | 13 |
| 2022.10.23. 23:45 | 13 |
| 2022.10.24. 00:00 | 13 |
| 2022.10.24. 00:15 | 13 |
| 2022.10.24. 00:30 | 13 |
| 2022.10.24. 00:45 | 13 |
| 2022.10.24. 01:00 | 13 |
| 2022.10.24. 01:15 | 13 |
| 2022.10.24. 01:30 | 13 |
| 2022.10.24. 01:45 | 13 |
| 2022.10.24. 02:00 | 13 |
| 2022.10.24. 02:15 | 13 |
| 2022.10.24. 02:30 | 13 |
| 2022.10.24. 02:45 | 13 |
| 2022.10.24. 03:00 | 13 |
| 2022.10.24. 03:15 | 13 |
| 2022.10.24. 03:30 | 13 |
| 2022.10.24. 03:45 | 13 |
| 2022.10.24. 04:00 | 13 |
| 2022.10.24. 04:15 | 13 |
| 2022.10.24. 04:30 | 13 |
| 2022.10.24. 04:45 | 13 |
| 2022.10.24. 05:00 | 13 |
| 2022.10.24. 05:15 | 13 |
| 2022.10.24. 05:30 | 13 |
| 2022.10.24. 05:45 | 13 |
| 2022.10.24. 06:00 | 13 |
| 2022.10.24. 06:15 | 13 |
| 2022.10.24. 06:30 | 13 |
| 2022.10.24. 06:45 | 13 |
| 2022.10.24. 07:00 | 13 |
| 2022.10.24. 07:15 | 13 |
| 2022.10.24. 07:30 | 13 |
| 2022.10.24. 07:45 | 13 |
| 2022.10.24. 08:00 | 13 |
| 2022.10.24. 08:15 | 13 |
| 2022.10.24. 08:30 | 13 |
| 2022.10.24. 08:45 | 13 |
| 2022.10.24. 09:00 | 13 |
| 2022.10.24. 09:15 | 13 |
| 2022.10.24. 09:30 | 13 |
| 2022.10.24. 09:45 | 13 |
| 2022.10.24. 10:00 | 13 |
| 2022.10.24. 10:15 | 13 |
| 2022.10.24. 10:30 | 13 |
| 2022.10.24. 10:45 | 13 |
| 2022.10.24. 11:00 | 13 |
| 2022.10.24. 11:15 | 13 |
| 2022.10.24. 11:30 | 13 |
| 2022.10.24. 11:45 | 13 |
| 2022.10.24. 12:00 | 13 |
| 2022.10.24. 12:15 | 13 |
| 2022.10.24. 12:30 | 13 |
| 2022.10.24. 12:45 | 13 |
| 2022.10.24. 13:00 | 13 |
| 2022.10.24. 13:15 | 13 |
| 2022.10.24. 13:30 | 13 |
| 2022.10.24. 13:45 | 13 |
| 2022.10.24. 14:00 | 13 |
| 2022.10.24. 14:15 | 13 |
| 2022.10.24. 14:30 | 13 |
| 2022.10.24. 14:45 | 13 |
| 2022.10.24. 15:00 | 13 |
| 2022.10.24. 15:15 | 13 |
| 2022.10.24. 15:30 | 13 |
| 2022.10.24. 15:45 | 13 |
| 2022.10.24. 16:00 | 13 |
| 2022.10.24. 16:15 | 13 |
| 2022.10.24. 16:30 | 13 |
| 2022.10.24. 16:45 | 13 |
| 2022.10.24. 17:00 | 13 |
| 2022.10.24. 17:15 | 13 |
| 2022.10.24. 17:30 | 13 |
| 2022.10.24. 17:45 | 13 |
| 2022.10.24. 18:00 | 13 |
| 2022.10.24. 18:15 | 13 |
| 2022.10.24. 18:30 | 13 |
| 2022.10.24. 18:45 | 13 |
| 2022.10.24. 19:00 | 13 |
| 2022.10.24. 19:15 | 13 |
| 2022.10.24. 19:30 | 13 |
| 2022.10.24. 19:45 | 13 |
| 2022.10.24. 20:00 | 13 |
| 2022.10.24. 20:15 | 13 |
| 2022.10.24. 20:30 | 13 |
| 2022.10.24. 20:45 | 13 |
| 2022.10.24. 21:00 | 13 |
| 2022.10.24. 21:15 | 13 |
| 2022.10.24. 21:30 | 13 |
| 2022.10.24. 21:45 | 13 |
| 2022.10.24. 22:00 | 13 |
| 2022.10.24. 22:15 | 13 |
| 2022.10.24. 22:30 | 13 |
| 2022.10.24. 22:45 | 13 |
| 2022.10.24. 23:00 | 13 |
| 2022.10.24. 23:15 | 13 |
| 2022.10.24. 23:30 | 13 |
| 2022.10.24. 23:45 | 13 |
| 2022.10.25. 00:00 | 13 |
| 2022.10.25. 00:15 | 13 |
| 2022.10.25. 00:30 | 13 |
| 2022.10.25. 00:45 | 13 |
| 2022.10.25. 01:00 | 13 |
| 2022.10.25. 01:15 | 13 |
| 2022.10.25. 01:30 | 13 |
| 2022.10.25. 01:45 | 13 |
| 2022.10.25. 02:00 | 13 |
| 2022.10.25. 02:15 | 13 |
| 2022.10.25. 02:30 | 13 |
| 2022.10.25. 02:45 | 13 |
| 2022.10.25. 02:00 | 13 |
| 2022.10.25. 02:15 | 13 |
| 2022.10.25. 02:30 | 13 |
| 2022.10.25. 02:45 | 13 |
| 2022.10.25. 03:00 | 13 |
| 2022.10.25. 03:15 | 13 |
| 2022.10.25. 03:30 | 13 |
| 2022.10.25. 03:45 | 13 |
| 2022.10.25. 04:00 | 13 |
| 2022.10.25. 04:15 | 13 |
| 2022.10.25. 04:30 | 13 |
| 2022.10.25. 04:45 | 13 |
| 2022.10.25. 05:00 | 13 |
| 2022.10.25. 05:15 | 13 |
| 2022.10.25. 05:30 | 13 |
| 2022.10.25. 05:45 | 13 |
| 2022.10.25. 06:00 | 13 |
| 2022.10.25. 06:15 | 13 |
| 2022.10.25. 06:30 | 13 |
| 2022.10.25. 06:45 | 13 |
| 2022.10.25. 07:00 | 13 |
| 2022.10.25. 07:15 | 13 |
| 2022.10.25. 07:30 | 13 |
| 2022.10.25. 07:45 | 13 |
| 2022.10.25. 08:00 | 13 |
| 2022.10.25. 08:15 | 13 |
| 2022.10.25. 08:30 | 13 |
| 2022.10.25. 08:45 | 13 |
| 2022.10.25. 09:00 | 13 |
| 2022.10.25. 09:15 | 13 |
| 2022.10.25. 09:30 | 13 |
| 2022.10.25. 09:45 | 13 |
| 2022.10.25. 10:00 | 13 |
| 2022.10.25. 10:15 | 13 |
| 2022.10.25. 10:30 | 13 |
| 2022.10.25. 10:45 | 13 |
| 2022.10.25. 11:00 | 13 |
| 2022.10.25. 11:15 | 13 |
| 2022.10.25. 11:30 | 13 |
| 2022.10.25. 11:45 | 13 |
| 2022.10.25. 12:00 | 13 |
| 2022.10.25. 12:15 | 13 |
| 2022.10.25. 12:30 | 13 |
| 2022.10.25. 12:45 | 13 |
| 2022.10.25. 13:00 | 13 |
| 2022.10.25. 13:15 | 13 |
| 2022.10.25. 13:30 | 13 |
| 2022.10.25. 13:45 | 13 |
| 2022.10.25. 14:00 | 13 |
| 2022.10.25. 14:15 | 13 |
| 2022.10.25. 14:30 | 13 |
| 2022.10.25. 14:45 | 13 |
| 2022.10.25. 15:00 | 13 |
| 2022.10.25. 15:15 | 13 |
| 2022.10.25. 15:30 | 13 |
| 2022.10.25. 15:45 | 13 |
| 2022.10.25. 16:00 | 13 |
| 2022.10.25. 16:15 | 13 |
| 2022.10.25. 16:30 | 13 |
| 2022.10.25. 16:45 | 13 |
| 2022.10.25. 17:00 | 13 |
| 2022.10.25. 17:15 | 13 |
| 2022.10.25. 17:30 | 13 |
| 2022.10.25. 17:45 | 13 |
| 2022.10.25. 18:00 | 13 |
| 2022.10.25. 18:15 | 13 |
| 2022.10.25. 18:30 | 13 |
| 2022.10.25. 18:45 | 13 |
| 2022.10.25. 19:00 | 13 |
| 2022.10.25. 19:15 | 13 |
| 2022.10.25. 19:30 | 13 |
| 2022.10.25. 19:45 | 13 |
| 2022.10.25. 20:00 | 13 |
| 2022.10.25. 20:15 | 13 |
| 2022.10.25. 20:30 | 13 |
| 2022.10.25. 20:45 | 13 |
| 2022.10.25. 21:00 | 13 |
| 2022.10.25. 21:15 | 13 |
| 2022.10.25. 21:30 | 13 |
| 2022.10.25. 21:45 | 13 |
| 2022.10.25. 22:00 | 13 |
| 2022.10.25. 22:15 | 13 |
| 2022.10.25. 22:30 | 13 |
| 2022.10.25. 22:45 | 13 |
| 2022.10.25. 23:00 | 13 |
| 2022.10.25. 23:15 | 13 |
| 2022.10.25. 23:30 | 13 |
| 2022.10.25. 23:45 | 13 |
| 2022.10.26. 00:00 | 13 |
| 2022.10.26. 00:15 | 13 |
| 2022.10.26. 00:30 | 13 |
| 2022.10.26. 00:45 | 13 |
| 2022.10.26. 01:00 | 13 |
| 2022.10.26. 01:15 | 13 |
| 2022.10.26. 01:30 | 13 |
| 2022.10.26. 01:45 | 13 |
| 2022.10.26. 02:00 | 13 |
| 2022.10.26. 02:15 | 13 |
| 2022.10.26. 02:30 | 13 |
| 2022.10.26. 02:45 | 13 |
| 2022.10.26. 03:00 | 13 |
| 2022.10.26. 03:15 | 13 |
| 2022.10.26. 03:30 | 13 |
| 2022.10.26. 03:45 | 13 |
| 2022.10.26. 04:00 | 13 |
| 2022.10.26. 04:15 | 13 |
| 2022.10.26. 04:30 | 13 |
| 2022.10.26. 04:45 | 13 |
| 2022.10.26. 05:00 | 13 |
| 2022.10.26. 05:15 | 13 |
| 2022.10.26. 05:30 | 13 |
| 2022.10.26. 05:45 | 13 |
| 2022.10.26. 06:00 | 13 |
| 2022.10.26. 06:15 | 13 |
| 2022.10.26. 06:30 | 13 |
| 2022.10.26. 06:45 | 13 |
| 2022.10.26. 07:00 | 13 |
| 2022.10.26. 07:15 | 13 |
| 2022.10.26. 07:30 | 13 |
| 2022.10.26. 07:45 | 13 |
| 2022.10.26. 08:00 | 13 |
| 2022.10.26. 08:15 | 13 |
| 2022.10.26. 08:30 | 13 |
| 2022.10.26. 08:45 | 13 |
| 2022.10.26. 09:00 | 13 |
| 2022.10.26. 09:15 | 13 |
| 2022.10.26. 09:30 | 13 |
| 2022.10.26. 09:45 | 13 |
| 2022.10.26. 10:00 | 13 |
| 2022.10.26. 10:15 | 13 |
| 2022.10.26. 10:30 | 13 |
| 2022.10.26. 10:45 | 13 |
| 2022.10.26. 11:00 | 13 |
| 2022.10.26. 11:15 | 13 |
| 2022.10.26. 11:30 | 13 |
| 2022.10.26. 11:45 | 13 |
| 2022.10.26. 12:00 | 13 |
| 2022.10.26. 12:15 | 13 |
| 2022.10.26. 12:30 | 13 |
| 2022.10.26. 12:45 | 13 |
| 2022.10.26. 13:00 | 13 |
| 2022.10.26. 13:15 | 13 |
| 2022.10.26. 13:30 | 13 |
| 2022.10.26. 13:45 | 13 |
| 2022.10.26. 14:00 | 13 |
| 2022.10.26. 14:15 | 13 |
| 2022.10.26. 14:30 | 13 |
| 2022.10.26. 14:45 | 13 |
| 2022.10.26. 15:00 | 13 |
| 2022.10.26. 15:15 | 13 |
| 2022.10.26. 15:30 | 13 |
| 2022.10.26. 15:45 | 13 |
| 2022.10.26. 16:00 | 13 |
| 2022.10.26. 16:15 | 13 |
| 2022.10.26. 16:30 | 13 |
| 2022.10.26. 16:45 | 13 |
| 2022.10.26. 17:00 | 13 |
| 2022.10.26. 17:15 | 13 |
| 2022.10.26. 17:30 | 13 |
| 2022.10.26. 17:45 | 13 |
| 2022.10.26. 18:00 | 13 |
| 2022.10.26. 18:15 | 13 |
| 2022.10.26. 18:30 | 13 |
| 2022.10.26. 18:45 | 13 |
| 2022.10.26. 19:00 | 13 |
| 2022.10.26. 19:15 | 13 |
| 2022.10.26. 19:30 | 13 |
| 2022.10.26. 19:45 | 13 |
| 2022.10.26. 20:00 | 13 |
| 2022.10.26. 20:15 | 13 |
| 2022.10.26. 20:30 | 13 |
| 2022.10.26. 20:45 | 13 |
| 2022.10.26. 21:00 | 13 |
| 2022.10.26. 21:15 | 13 |
| 2022.10.26. 21:30 | 13 |
| 2022.10.26. 21:45 | 13 |
| 2022.10.26. 22:00 | 13 |
| 2022.10.26. 22:15 | 13 |
| 2022.10.26. 22:30 | 13 |
| 2022.10.26. 22:45 | 13 |
| 2022.10.26. 23:00 | 13 |
| 2022.10.26. 23:15 | 13 |
| 2022.10.26. 23:30 | 13 |
| 2022.10.26. 23:45 | 13 |
| 2022.10.27. 00:00 | 13 |
| 2022.10.27. 00:15 | 13 |
| 2022.10.27. 00:30 | 13 |
| 2022.10.27. 00:45 | 13 |
| 2022.10.27. 01:00 | 13 |
| 2022.10.27. 01:15 | 13 |
| 2022.10.27. 01:30 | 13 |
| 2022.10.27. 01:45 | 13 |
| 2022.10.27. 02:00 | 13 |
| 2022.10.27. 02:15 | 13 |
| 2022.10.27. 02:30 | 13 |
| 2022.10.27. 02:45 | 13 |
| 2022.10.27. 03:00 | 13 |
| 2022.10.27. 03:15 | 13 |
| 2022.10.27. 03:30 | 13 |
| 2022.10.27. 03:45 | 13 |
| 2022.10.27. 04:00 | 13 |
| 2022.10.27. 04:15 | 13 |
| 2022.10.27. 04:30 | 13 |
| 2022.10.27. 04:45 | 13 |
| 2022.10.27. 05:00 | 13 |
| 2022.10.27. 05:15 | 13 |
| 2022.10.27. 05:30 | 13 |
| 2022.10.27. 05:45 | 13 |
| 2022.10.27. 06:00 | 13 |
| 2022.10.27. 06:15 | 13 |
| 2022.10.27. 06:30 | 13 |
| 2022.10.27. 06:45 | 13 |
| 2022.10.27. 07:00 | 13 |
| 2022.10.27. 07:15 | 13 |
| 2022.10.27. 07:30 | 13 |
| 2022.10.27. 07:45 | 13 |
| 2022.10.27. 08:00 | 13 |
| 2022.10.27. 08:15 | 13 |
| 2022.10.27. 08:30 | 13 |
| 2022.10.27. 08:45 | 13 |
| 2022.10.27. 09:00 | 13 |
| 2022.10.27. 09:15 | 13 |
| 2022.10.27. 09:30 | 13 |
| 2022.10.27. 09:45 | 13 |
| 2022.10.27. 10:00 | 13 |
| 2022.10.27. 10:15 | 13 |
| 2022.10.27. 10:30 | 13 |
| 2022.10.27. 10:45 | 13 |
| 2022.10.27. 11:00 | 13 |
| 2022.10.27. 11:15 | 13 |
| 2022.10.27. 11:30 | 13 |
| 2022.10.27. 11:45 | 13 |
| 2022.10.27. 12:00 | 13 |
| 2022.10.27. 12:15 | 13 |
| 2022.10.27. 12:30 | 13 |
| 2022.10.27. 12:45 | 13 |
| 2022.10.27. 13:00 | 13 |
| 2022.10.27. 13:15 | 13 |
| 2022.10.27. 13:30 | 13 |
| 2022.10.27. 13:45 | 13 |
| 2022.10.27. 14:00 | 13 |
| 2022.10.27. 14:15 | 13 |
| 2022.10.27. 14:30 | 13 |
| 2022.10.27. 14:45 | 13 |
| 2022.10.27. 15:00 | 13 |
| 2022.10.27. 15:15 | 13 |
| 2022.10.27. 15:30 | 13 |
| 2022.10.27. 15:45 | 13 |
| 2022.10.27. 16:00 | 13 |
| 2022.10.27. 16:15 | 13 |
| 2022.10.27. 16:30 | 13 |
| 2022.10.27. 16:45 | 13 |
| 2022.10.27. 17:00 | 13 |
| 2022.10.27. 17:15 | 13 |
| 2022.10.27. 17:30 | 13 |
| 2022.10.27. 17:45 | 13 |
| 2022.10.27. 18:00 | 13 |
| 2022.10.27. 18:15 | 13 |
| 2022.10.27. 18:30 | 13 |
| 2022.10.27. 18:45 | 13 |
| 2022.10.27. 19:00 | 13 |
| 2022.10.27. 19:15 | 13 |
| 2022.10.27. 19:30 | 13 |
| 2022.10.27. 19:45 | 13 |
| 2022.10.27. 20:00 | 13 |
| 2022.10.27. 20:15 | 13 |
| 2022.10.27. 20:30 | 13 |
| 2022.10.27. 20:45 | 13 |
| 2022.10.27. 21:00 | 13 |
| 2022.10.27. 21:15 | 13 |
| 2022.10.27. 21:30 | 13 |
| 2022.10.27. 21:45 | 13 |
| 2022.10.27. 22:00 | 13 |
| 2022.10.27. 22:15 | 13 |
| 2022.10.27. 22:30 | 13 |
| 2022.10.27. 22:45 | 13 |
| 2022.10.27. 23:00 | 13 |
| 2022.10.27. 23:15 | 13 |
| 2022.10.27. 23:30 | 13 |
| 2022.10.27. 23:45 | 13 |
| 2022.10.28. 00:00 | 13 |
| 2022.10.28. 00:15 | 13 |
| 2022.10.28. 00:30 | 13 |
| 2022.10.28. 00:45 | 13 |
| 2022.10.28. 01:00 | 13 |
| 2022.10.28. 01:15 | 13 |
| 2022.10.28. 01:30 | 13 |
| 2022.10.28. 01:45 | 13 |
| 2022.10.28. 02:00 | 13 |
| 2022.10.28. 02:15 | 13 |
| 2022.10.28. 02:30 | 13 |
| 2022.10.28. 02:45 | 13 |
| 2022.10.28. 03:00 | 13 |
| 2022.10.28. 03:15 | 13 |
| 2022.10.28. 03:30 | 13 |
| 2022.10.28. 03:45 | 13 |
| 2022.10.28. 04:00 | 13 |
| 2022.10.28. 04:15 | 13 |
| 2022.10.28. 04:30 | 13 |
| 2022.10.28. 04:45 | 13 |
| 2022.10.28. 05:00 | 13 |
| 2022.10.28. 05:15 | 13 |
| 2022.10.28. 05:30 | 13 |
| 2022.10.28. 05:45 | 13 |
| 2022.10.28. 06:00 | 13 |
| 2022.10.28. 06:15 | 13 |
| 2022.10.28. 06:30 | 13 |
| 2022.10.28. 06:45 | 13 |
| 2022.10.28. 07:00 | 13 |
| 2022.10.28. 07:15 | 13 |
| 2022.10.28. 07:30 | 13 |
| 2022.10.28. 07:45 | 13 |
| 2022.10.28. 08:00 | 13 |
| 2022.10.28. 08:15 | 13 |
| 2022.10.28. 08:30 | 13 |
| 2022.10.28. 08:45 | 13 |
| 2022.10.28. 09:00 | 13 |
| 2022.10.28. 09:15 | 13 |
| 2022.10.28. 09:30 | 13 |
| 2022.10.28. 09:45 | 13 |
| 2022.10.28. 10:00 | 13 |
| 2022.10.28. 10:15 | 13 |
| 2022.10.28. 10:30 | 13 |
| 2022.10.28. 10:45 | 13 |
| 2022.10.28. 11:00 | 13 |
| 2022.10.28. 11:15 | 13 |
| 2022.10.28. 11:30 | 13 |
| 2022.10.28. 11:45 | 13 |
| 2022.10.28. 12:00 | 13 |
| 2022.10.28. 12:15 | 13 |
| 2022.10.28. 12:30 | 13 |
| 2022.10.28. 12:45 | 13 |
| 2022.10.28. 13:00 | 13 |
| 2022.10.28. 13:15 | 13 |
| 2022.10.28. 13:30 | 13 |
| 2022.10.28. 13:45 | 13 |
| 2022.10.28. 14:00 | 13 |
| 2022.10.28. 14:15 | 13 |
| 2022.10.28. 14:30 | 13 |
| 2022.10.28. 14:45 | 13 |
| 2022.10.28. 15:00 | 13 |
| 2022.10.28. 15:15 | 13 |
| 2022.10.28. 15:30 | 13 |
| 2022.10.28. 15:45 | 13 |
| 2022.10.28. 16:00 | 13 |
| 2022.10.28. 16:15 | 13 |
| 2022.10.28. 16:30 | 13 |
| 2022.10.28. 16:45 | 13 |
| 2022.10.28. 17:00 | 13 |
| 2022.10.28. 17:15 | 13 |
| 2022.10.28. 17:30 | 13 |
| 2022.10.28. 17:45 | 13 |
| 2022.10.28. 18:00 | 13 |
| 2022.10.28. 18:15 | 13 |
| 2022.10.28. 18:30 | 13 |
| 2022.10.28. 18:45 | 13 |
| 2022.10.28. 19:00 | 13 |
| 2022.10.28. 19:15 | 13 |
| 2022.10.28. 19:30 | 13 |
| 2022.10.28. 19:45 | 13 |
| 2022.10.28. 20:00 | 13 |
| 2022.10.28. 20:15 | 13 |
| 2022.10.28. 20:30 | 13 |
| 2022.10.28. 20:45 | 13 |
| 2022.10.28. 21:00 | 13 |
| 2022.10.28. 21:15 | 13 |
| 2022.10.28. 21:30 | 13 |
| 2022.10.28. 21:45 | 13 |
| 2022.10.28. 22:00 | 13 |
| 2022.10.28. 22:15 | 13 |
| 2022.10.28. 22:30 | 13 |
| 2022.10.28. 22:45 | 13 |
| 2022.10.28. 23:00 | 13 |
| 2022.10.28. 23:15 | 13 |
| 2022.10.28. 23:30 | 13 |
| 2022.10.28. 23:45 | 13 |
| 2022.10.29. 00:00 | 13 |
| 2022.10.29. 00:15 | 13 |
| 2022.10.29. 00:30 | 13 |
| 2022.10.29. 00:45 | 13 |
| 2022.10.29. 01:00 | 13 |
| 2022.10.29. 01:15 | 13 |
| 2022.10.29. 01:30 | 13 |
| 2022.10.29. 01:45 | 13 |
| 2022.10.29. 02:00 | 13 |
| 2022.10.29. 02:15 | 13 |
| 2022.10.29. 02:30 | 13 |
| 2022.10.29. 02:45 | 13 |
| 2022.10.29. 03:00 | 13 |
| 2022.10.29. 03:15 | 13 |
| 2022.10.29. 03:30 | 13 |
| 2022.10.29. 03:45 | 13 |
| 2022.10.29. 04:00 | 13 |
| 2022.10.29. 04:15 | 13 |
| 2022.10.29. 04:30 | 13 |
| 2022.10.29. 04:45 | 13 |
| 2022.10.29. 05:00 | 13 |
| 2022.10.29. 05:15 | 13 |
| 2022.10.29. 05:30 | 13 |
| 2022.10.29. 05:45 | 13 |
| 2022.10.29. 06:00 | 13 |
| 2022.10.29. 06:15 | 13 |
| 2022.10.29. 06:30 | 13 |
| 2022.10.29. 06:45 | 13 |
| 2022.10.29. 07:00 | 13 |
| 2022.10.29. 07:15 | 13 |
| 2022.10.29. 07:30 | 13 |
| 2022.10.29. 07:45 | 13 |
| 2022.10.29. 08:00 | 13 |
| 2022.10.29. 08:15 | 13 |
| 2022.10.29. 08:30 | 13 |
| 2022.10.29. 08:45 | 13 |
| 2022.10.29. 09:00 | 13 |
| 2022.10.29. 09:15 | 13 |
| 2022.10.29. 09:30 | 13 |
| 2022.10.29. 09:45 | 13 |
| 2022.10.29. 10:00 | 13 |
| 2022.10.29. 10:15 | 13 |
| 2022.10.29. 10:30 | 13 |
| 2022.10.29. 10:45 | 13 |
| 2022.10.29. 11:00 | 13 |
| 2022.10.29. 11:15 | 13 |
| 2022.10.29. 11:30 | 13 |
| 2022.10.29. 11:45 | 13 |
| 2022.10.29. 12:00 | 13 |
| 2022.10.29. 12:15 | 13 |
| 2022.10.29. 12:30 | 13 |
| 2022.10.29. 12:45 | 13 |
| 2022.10.29. 13:00 | 13 |
| 2022.10.29. 13:15 | 13 |
| 2022.10.29. 13:30 | 13 |
| 2022.10.29. 13:45 | 13 |
| 2022.10.29. 14:00 | 13 |
| 2022.10.29. 14:15 | 13 |
| 2022.10.29. 14:30 | 13 |
| 2022.10.29. 14:45 | 13 |
| 2022.10.29. 15:00 | 13 |
| 2022.10.29. 15:15 | 13 |
| 2022.10.29. 15:30 | 13 |
| 2022.10.29. 15:45 | 13 |
| 2022.10.29. 16:00 | 13 |
| 2022.10.29. 16:15 | 13 |
| 2022.10.29. 16:30 | 13 |
| 2022.10.29. 16:45 | 13 |
| 2022.10.29. 17:00 | 13 |
| 2022.10.29. 17:15 | 13 |
| 2022.10.29. 17:30 | 13 |
| 2022.10.29. 17:45 | 13 |
| 2022.10.29. 18:00 | 13 |
| 2022.10.29. 18:15 | 13 |
| 2022.10.29. 18:30 | 13 |
| 2022.10.29. 18:45 | 13 |
| 2022.10.29. 19:00 | 13 |
| 2022.10.29. 19:15 | 13 |
| 2022.10.29. 19:30 | 13 |
| 2022.10.29. 19:45 | 13 |
| 2022.10.29. 20:00 | 13 |
| 2022.10.29. 20:15 | 13 |
| 2022.10.29. 20:30 | 13 |
| 2022.10.29. 20:45 | 13 |
| 2022.10.29. 21:00 | 13 |
| 2022.10.29. 21:15 | 13 |
| 2022.10.29. 21:30 | 13 |
| 2022.10.29. 21:45 | 13 |
| 2022.10.29. 22:00 | 13 |
| 2022.10.29. 22:15 | 13 |
| 2022.10.29. 22:30 | 13 |
| 2022.10.29. 22:45 | 13 |
| 2022.10.29. 23:00 | 13 |
| 2022.10.29. 23:15 | 13 |
| 2022.10.29. 23:30 | 13 |
| 2022.10.29. 23:45 | 13 |
| 2022.10.30. 00:00 | 13 |
| 2022.10.30. 00:15 | 13 |
| 2022.10.30. 00:30 | 13 |
| 2022.10.30. 00:45 | 13 |
| 2022.10.30. 01:00 | 13 |
| 2022.10.30. 01:15 | 13 |
| 2022.10.30. 01:30 | 13 |
| 2022.10.30. 01:45 | 13 |
| 2022.10.30. 02:00 | 13 |
| 2022.10.30. 02:15 | 13 |
| 2022.10.30. 02:30 | 13 |
| 2022.10.30. 02:45 | 13 |
| 2022.10.30. 03:00 | 13 |
| 2022.10.30. 03:15 | 13 |
| 2022.10.30. 03:30 | 13 |
| 2022.10.30. 03:45 | 13 |
| 2022.10.30. 04:00 | 13 |
| 2022.10.30. 04:15 | 13 |
| 2022.10.30. 04:30 | 13 |
| 2022.10.30. 04:45 | 13 |
| 2022.10.30. 05:00 | 13 |
| 2022.10.30. 05:15 | 13 |
| 2022.10.30. 05:30 | 13 |
| 2022.10.30. 05:45 | 13 |
| 2022.10.30. 06:00 | 13 |
| 2022.10.30. 06:15 | 13 |
| 2022.10.30. 06:30 | 13 |
| 2022.10.30. 06:45 | 13 |
| 2022.10.30. 07:00 | 13 |
| 2022.10.30. 07:15 | 13 |
| 2022.10.30. 07:30 | 13 |
| 2022.10.30. 07:45 | 13 |
| 2022.10.30. 08:00 | 13 |
| 2022.10.30. 08:15 | 13 |
| 2022.10.30. 08:30 | 13 |
| 2022.10.30. 08:45 | 13 |
| 2022.10.30. 09:00 | 13 |
| 2022.10.30. 09:15 | 13 |
| 2022.10.30. 09:30 | 13 |
| 2022.10.30. 09:45 | 13 |
| 2022.10.30. 10:00 | 13 |
| 2022.10.30. 10:15 | 13 |
| 2022.10.30. 10:30 | 13 |
| 2022.10.30. 10:45 | 13 |
| 2022.10.30. 11:00 | 13 |
| 2022.10.30. 11:15 | 13 |
| 2022.10.30. 11:30 | 13 |
| 2022.10.30. 11:45 | 13 |
| 2022.10.30. 12:00 | 13 |
| 2022.10.30. 12:15 | 13 |
| 2022.10.30. 12:30 | 13 |
| 2022.10.30. 12:45 | 13 |
| 2022.10.30. 13:00 | 13 |
| 2022.10.30. 13:15 | 13 |
| 2022.10.30. 13:30 | 13 |
| 2022.10.30. 13:45 | 13 |
| 2022.10.30. 14:00 | 13 |
| 2022.10.30. 14:15 | 13 |
| 2022.10.30. 14:30 | 13 |
| 2022.10.30. 14:45 | 13 |
| 2022.10.30. 15:00 | 13 |
| 2022.10.30. 15:15 | 13 |
| 2022.10.30. 15:30 | 13 |
| 2022.10.30. 15:45 | 13 |
| 2022.10.30. 16:00 | 13 |
| 2022.10.30. 16:15 | 13 |
| 2022.10.30. 16:30 | 13 |
| 2022.10.30. 16:45 | 13 |
| 2022.10.30. 17:00 | 13 |
| 2022.10.30. 17:15 | 13 |
| 2022.10.30. 17:30 | 13 |
| 2022.10.30. 17:45 | 13 |
| 2022.10.30. 18:00 | 13 |
| 2022.10.30. 18:15 | 13 |
| 2022.10.30. 18:30 | 13 |
| 2022.10.30. 18:45 | 13 |
| 2022.10.30. 19:00 | 13 |
| 2022.10.30. 19:15 | 13 |
| 2022.10.30. 19:30 | 13 |
| 2022.10.30. 19:45 | 13 |
| 2022.10.30. 20:00 | 13 |
| 2022.10.30. 20:15 | 13 |
| 2022.10.30. 20:30 | 13 |
| 2022.10.30. 20:45 | 13 |
| 2022.10.30. 21:00 | 13 |
| 2022.10.30. 21:15 | 13 |
| 2022.10.30. 21:30 | 13 |
| 2022.10.30. 21:45 | 13 |
| 2022.10.30. 22:00 | 13 |
| 2022.10.30. 22:15 | 13 |
| 2022.10.30. 22:30 | 13 |
| 2022.10.30. 22:45 | 13 |
| 2022.10.30. 23:00 | 13 |
| 2022.10.30. 23:15 | 13 |
| 2022.10.30. 23:30 | 13 |
| 2022.10.30. 23:45 | 13 |
| 2022.10.31. 00:00 | 13 |
| 2022.10.31. 00:15 | 13 |
| 2022.10.31. 00:30 | 13 |
| 2022.10.31. 00:45 | 13 |
| 2022.10.31. 01:00 | 13 |
| 2022.10.31. 01:15 | 13 |
| 2022.10.31. 01:30 | 13 |
| 2022.10.31. 01:45 | 13 |
| 2022.10.31. 02:00 | 13 |
| 2022.10.31. 02:15 | 13 |
| 2022.10.31. 02:30 | 13 |
| 2022.10.31. 02:45 | 13 |
| 2022.10.31. 03:00 | 13 |
| 2022.10.31. 03:15 | 13 |
| 2022.10.31. 03:30 | 13 |
| 2022.10.31. 03:45 | 13 |
| 2022.10.31. 04:00 | 13 |
| 2022.10.31. 04:15 | 13 |
| 2022.10.31. 04:30 | 13 |
| 2022.10.31. 04:45 | 13 |
| 2022.10.31. 05:00 | 13 |
| 2022.10.31. 05:15 | 13 |
| 2022.10.31. 05:30 | 13 |
| 2022.10.31. 05:45 | 13 |
| 2022.10.31. 06:00 | 13 |
| 2022.10.31. 06:15 | 13 |
| 2022.10.31. 06:30 | 13 |
| 2022.10.31. 06:45 | 13 |
| 2022.10.31. 07:00 | 13 |
| 2022.10.31. 07:15 | 13 |
| 2022.10.31. 07:30 | 13 |
| 2022.10.31. 07:45 | 13 |
| 2022.10.31. 08:00 | 13 |
| 2022.10.31. 08:15 | 13 |
| 2022.10.31. 08:30 | 13 |
| 2022.10.31. 08:45 | 13 |
| 2022.10.31. 09:00 | 13 |
| 2022.10.31. 09:15 | 13 |
| 2022.10.31. 09:30 | 13 |
| 2022.10.31. 09:45 | 13 |
| 2022.10.31. 10:00 | 13 |
| 2022.10.31. 10:15 | 13 |
| 2022.10.31. 10:30 | 13 |
| 2022.10.31. 10:45 | 13 |
| 2022.10.31. 11:00 | 13 |
| 2022.10.31. 11:15 | 13 |
| 2022.10.31. 11:30 | 13 |
| 2022.10.31. 11:45 | 13 |
| 2022.10.31. 12:00 | 13 |
| 2022.10.31. 12:15 | 13 |
| 2022.10.31. 12:30 | 13 |
| 2022.10.31. 12:45 | 13 |
| 2022.10.31. 13:00 | 13 |
| 2022.10.31. 13:15 | 13 |
| 2022.10.31. 13:30 | 13 |
| 2022.10.31. 13:45 | 13 |
| 2022.10.31. 14:00 | 13 |
| 2022.10.31. 14:15 | 13 |
| 2022.10.31. 14:30 | 13 |
| 2022.10.31. 14:45 | 13 |
| 2022.10.31. 15:00 | 13 |
| 2022.10.31. 15:15 | 13 |
| 2022.10.31. 15:30 | 13 |
| 2022.10.31. 15:45 | 13 |
| 2022.10.31. 16:00 | 13 |
| 2022.10.31. 16:15 | 13 |
| 2022.10.31. 16:30 | 13 |
| 2022.10.31. 16:45 | 13 |
| 2022.10.31. 17:00 | 13 |
| 2022.10.31. 17:15 | 13 |
| 2022.10.31. 17:30 | 13 |
| 2022.10.31. 17:45 | 13 |
| 2022.10.31. 18:00 | 13 |
| 2022.10.31. 18:15 | 13 |
| 2022.10.31. 18:30 | 13 |
| 2022.10.31. 18:45 | 13 |
| 2022.10.31. 19:00 | 13 |
| 2022.10.31. 19:15 | 13 |
| 2022.10.31. 19:30 | 13 |
| 2022.10.31. 19:45 | 13 |
| 2022.10.31. 20:00 | 13 |
| 2022.10.31. 20:15 | 13 |
| 2022.10.31. 20:30 | 13 |
| 2022.10.31. 20:45 | 13 |
| 2022.10.31. 21:00 | 13 |
| 2022.10.31. 21:15 | 13 |
| 2022.10.31. 21:30 | 13 |
| 2022.10.31. 21:45 | 13 |
| 2022.10.31. 22:00 | 13 |
| 2022.10.31. 22:15 | 13 |
| 2022.10.31. 22:30 | 13 |
| 2022.10.31. 22:45 | 13 |
| 2022.10.31. 23:00 | 13 |
| 2022.10.31. 23:15 | 13 |
| 2022.10.31. 23:30 | 13 |
| 2022.10.31. 23:45 | 13 |
| 2022.11.01. 00:00 | 11 |
| 2022.11.01. 00:15 | 11 |
| 2022.11.01. 00:30 | 11 |
| 2022.11.01. 00:45 | 11 |
| 2022.11.01. 01:00 | 11 |
| 2022.11.01. 01:15 | 11 |
| 2022.11.01. 01:30 | 11 |
| 2022.11.01. 01:45 | 11 |
| 2022.11.01. 02:00 | 11 |
| 2022.11.01. 02:15 | 11 |
| 2022.11.01. 02:30 | 11 |
| 2022.11.01. 02:45 | 11 |
| 2022.11.01. 03:00 | 11 |
| 2022.11.01. 03:15 | 11 |
| 2022.11.01. 03:30 | 11 |
| 2022.11.01. 03:45 | 11 |
| 2022.11.01. 04:00 | 11 |
| 2022.11.01. 04:15 | 11 |
| 2022.11.01. 04:30 | 11 |
| 2022.11.01. 04:45 | 11 |
| 2022.11.01. 05:00 | 11 |
| 2022.11.01. 05:15 | 11 |
| 2022.11.01. 05:30 | 11 |
| 2022.11.01. 05:45 | 11 |
| 2022.11.01. 06:00 | 11 |
| 2022.11.01. 06:15 | 11 |
| 2022.11.01. 06:30 | 11 |
| 2022.11.01. 06:45 | 11 |
| 2022.11.01. 07:00 | 11 |
| 2022.11.01. 07:15 | 11 |
| 2022.11.01. 07:30 | 11 |
| 2022.11.01. 07:45 | 11 |
| 2022.11.01. 08:00 | 11 |
| 2022.11.01. 08:15 | 11 |
| 2022.11.01. 08:30 | 11 |
| 2022.11.01. 08:45 | 11 |
| 2022.11.01. 09:00 | 11 |
| 2022.11.01. 09:15 | 11 |
| 2022.11.01. 09:30 | 11 |
| 2022.11.01. 09:45 | 11 |
| 2022.11.01. 10:00 | 11 |
| 2022.11.01. 10:15 | 11 |
| 2022.11.01. 10:30 | 11 |
| 2022.11.01. 10:45 | 11 |
| 2022.11.01. 11:00 | 11 |
| 2022.11.01. 11:15 | 11 |
| 2022.11.01. 11:30 | 11 |
| 2022.11.01. 11:45 | 11 |
| 2022.11.01. 12:00 | 11 |
| 2022.11.01. 12:15 | 11 |
| 2022.11.01. 12:30 | 11 |
| 2022.11.01. 12:45 | 11 |
| 2022.11.01. 13:00 | 11 |
| 2022.11.01. 13:15 | 11 |
| 2022.11.01. 13:30 | 11 |
| 2022.11.01. 13:45 | 11 |
| 2022.11.01. 14:00 | 11 |
| 2022.11.01. 14:15 | 11 |
| 2022.11.01. 14:30 | 11 |
| 2022.11.01. 14:45 | 11 |
| 2022.11.01. 15:00 | 11 |
| 2022.11.01. 15:15 | 11 |
| 2022.11.01. 15:30 | 11 |
| 2022.11.01. 15:45 | 11 |
| 2022.11.01. 16:00 | 11 |
| 2022.11.01. 16:15 | 11 |
| 2022.11.01. 16:30 | 11 |
| 2022.11.01. 16:45 | 11 |
| 2022.11.01. 17:00 | 11 |
| 2022.11.01. 17:15 | 11 |
| 2022.11.01. 17:30 | 11 |
| 2022.11.01. 17:45 | 11 |
| 2022.11.01. 18:00 | 11 |
| 2022.11.01. 18:15 | 11 |
| 2022.11.01. 18:30 | 11 |
| 2022.11.01. 18:45 | 11 |
| 2022.11.01. 19:00 | 11 |
| 2022.11.01. 19:15 | 11 |
| 2022.11.01. 19:30 | 11 |
| 2022.11.01. 19:45 | 11 |
| 2022.11.01. 20:00 | 11 |
| 2022.11.01. 20:15 | 11 |
| 2022.11.01. 20:30 | 11 |
| 2022.11.01. 20:45 | 11 |
| 2022.11.01. 21:00 | 11 |
| 2022.11.01. 21:15 | 11 |
| 2022.11.01. 21:30 | 11 |
| 2022.11.01. 21:45 | 11 |
| 2022.11.01. 22:00 | 11 |
| 2022.11.01. 22:15 | 11 |
| 2022.11.01. 22:30 | 11 |
| 2022.11.01. 22:45 | 11 |
| 2022.11.01. 23:00 | 11 |
| 2022.11.01. 23:15 | 11 |
| 2022.11.01. 23:30 | 11 |
| 2022.11.01. 23:45 | 11 |
| 2022.11.02. 00:00 | 11 |
| 2022.11.02. 00:15 | 11 |
| 2022.11.02. 00:30 | 11 |
| 2022.11.02. 00:45 | 11 |
| 2022.11.02. 01:00 | 11 |
| 2022.11.02. 01:15 | 11 |
| 2022.11.02. 01:30 | 11 |
| 2022.11.02. 01:45 | 11 |
| 2022.11.02. 02:00 | 11 |
| 2022.11.02. 02:15 | 11 |
| 2022.11.02. 02:30 | 11 |
| 2022.11.02. 02:45 | 11 |
| 2022.11.02. 03:00 | 11 |
| 2022.11.02. 03:15 | 11 |
| 2022.11.02. 03:30 | 11 |
| 2022.11.02. 03:45 | 11 |
| 2022.11.02. 04:00 | 11 |
| 2022.11.02. 04:15 | 11 |
| 2022.11.02. 04:30 | 11 |
| 2022.11.02. 04:45 | 11 |
| 2022.11.02. 05:00 | 11 |
| 2022.11.02. 05:15 | 11 |
| 2022.11.02. 05:30 | 11 |
| 2022.11.02. 05:45 | 11 |
| 2022.11.02. 06:00 | 11 |
| 2022.11.02. 06:15 | 11 |
| 2022.11.02. 06:30 | 11 |
| 2022.11.02. 06:45 | 11 |
| 2022.11.02. 07:00 | 11 |
| 2022.11.02. 07:15 | 11 |
| 2022.11.02. 07:30 | 11 |
| 2022.11.02. 07:45 | 11 |
| 2022.11.02. 08:00 | 11 |
| 2022.11.02. 08:15 | 11 |
| 2022.11.02. 08:30 | 11 |
| 2022.11.02. 08:45 | 11 |
| 2022.11.02. 09:00 | 11 |
| 2022.11.02. 09:15 | 11 |
| 2022.11.02. 09:30 | 11 |
| 2022.11.02. 09:45 | 11 |
| 2022.11.02. 10:00 | 11 |
| 2022.11.02. 10:15 | 11 |
| 2022.11.02. 10:30 | 11 |
| 2022.11.02. 10:45 | 11 |
| 2022.11.02. 11:00 | 11 |
| 2022.11.02. 11:15 | 11 |
| 2022.11.02. 11:30 | 11 |
| 2022.11.02. 11:45 | 11 |
| 2022.11.02. 12:00 | 11 |
| 2022.11.02. 12:15 | 11 |
| 2022.11.02. 12:30 | 11 |
| 2022.11.02. 12:45 | 11 |
| 2022.11.02. 13:00 | 11 |
| 2022.11.02. 13:15 | 11 |
| 2022.11.02. 13:30 | 11 |
| 2022.11.02. 13:45 | 11 |
| 2022.11.02. 14:00 | 11 |
| 2022.11.02. 14:15 | 11 |
| 2022.11.02. 14:30 | 11 |
| 2022.11.02. 14:45 | 11 |
| 2022.11.02. 15:00 | 11 |
| 2022.11.02. 15:15 | 11 |
| 2022.11.02. 15:30 | 11 |
| 2022.11.02. 15:45 | 11 |
| 2022.11.02. 16:00 | 11 |
| 2022.11.02. 16:15 | 11 |
| 2022.11.02. 16:30 | 11 |
| 2022.11.02. 16:45 | 11 |
| 2022.11.02. 17:00 | 11 |
| 2022.11.02. 17:15 | 11 |
| 2022.11.02. 17:30 | 11 |
| 2022.11.02. 17:45 | 11 |
| 2022.11.02. 18:00 | 11 |
| 2022.11.02. 18:15 | 11 |
| 2022.11.02. 18:30 | 11 |
| 2022.11.02. 18:45 | 11 |
| 2022.11.02. 19:00 | 11 |
| 2022.11.02. 19:15 | 11 |
| 2022.11.02. 19:30 | 11 |
| 2022.11.02. 19:45 | 11 |
| 2022.11.02. 20:00 | 11 |
| 2022.11.02. 20:15 | 11 |
| 2022.11.02. 20:30 | 11 |
| 2022.11.02. 20:45 | 11 |
| 2022.11.02. 21:00 | 11 |
| 2022.11.02. 21:15 | 11 |
| 2022.11.02. 21:30 | 11 |
| 2022.11.02. 21:45 | 11 |
| 2022.11.02. 22:00 | 11 |
| 2022.11.02. 22:15 | 11 |
| 2022.11.02. 22:30 | 11 |
| 2022.11.02. 22:45 | 11 |
| 2022.11.02. 23:00 | 11 |
| 2022.11.02. 23:15 | 11 |
| 2022.11.02. 23:30 | 11 |
| 2022.11.02. 23:45 | 11 |
| 2022.11.03. 00:00 | 11 |
| 2022.11.03. 00:15 | 11 |
| 2022.11.03. 00:30 | 11 |
| 2022.11.03. 00:45 | 11 |
| 2022.11.03. 01:00 | 11 |
| 2022.11.03. 01:15 | 11 |
| 2022.11.03. 01:30 | 11 |
| 2022.11.03. 01:45 | 11 |
| 2022.11.03. 02:00 | 11 |
| 2022.11.03. 02:15 | 11 |
| 2022.11.03. 02:30 | 11 |
| 2022.11.03. 02:45 | 11 |
| 2022.11.03. 03:00 | 11 |
| 2022.11.03. 03:15 | 11 |
| 2022.11.03. 03:30 | 11 |
| 2022.11.03. 03:45 | 11 |
| 2022.11.03. 04:00 | 11 |
| 2022.11.03. 04:15 | 11 |
| 2022.11.03. 04:30 | 11 |
| 2022.11.03. 04:45 | 11 |
| 2022.11.03. 05:00 | 11 |
| 2022.11.03. 05:15 | 11 |
| 2022.11.03. 05:30 | 11 |
| 2022.11.03. 05:45 | 11 |
| 2022.11.03. 06:00 | 11 |
| 2022.11.03. 06:15 | 11 |
| 2022.11.03. 06:30 | 11 |
| 2022.11.03. 06:45 | 11 |
| 2022.11.03. 07:00 | 11 |
| 2022.11.03. 07:15 | 11 |
| 2022.11.03. 07:30 | 11 |
| 2022.11.03. 07:45 | 11 |
| 2022.11.03. 08:00 | 11 |
| 2022.11.03. 08:15 | 11 |
| 2022.11.03. 08:30 | 11 |
| 2022.11.03. 08:45 | 11 |
| 2022.11.03. 09:00 | 11 |
| 2022.11.03. 09:15 | 11 |
| 2022.11.03. 09:30 | 11 |
| 2022.11.03. 09:45 | 11 |
| 2022.11.03. 10:00 | 11 |
| 2022.11.03. 10:15 | 11 |
| 2022.11.03. 10:30 | 11 |
| 2022.11.03. 10:45 | 11 |
| 2022.11.03. 11:00 | 11 |
| 2022.11.03. 11:15 | 11 |
| 2022.11.03. 11:30 | 11 |
| 2022.11.03. 11:45 | 11 |
| 2022.11.03. 12:00 | 11 |
| 2022.11.03. 12:15 | 11 |
| 2022.11.03. 12:30 | 11 |
| 2022.11.03. 12:45 | 11 |
| 2022.11.03. 13:00 | 11 |
| 2022.11.03. 13:15 | 11 |
| 2022.11.03. 13:30 | 11 |
| 2022.11.03. 13:45 | 11 |
| 2022.11.03. 14:00 | 11 |
| 2022.11.03. 14:15 | 11 |
| 2022.11.03. 14:30 | 11 |
| 2022.11.03. 14:45 | 11 |
| 2022.11.03. 15:00 | 11 |
| 2022.11.03. 15:15 | 11 |
| 2022.11.03. 15:30 | 11 |
| 2022.11.03. 15:45 | 11 |
| 2022.11.03. 16:00 | 11 |
| 2022.11.03. 16:15 | 11 |
| 2022.11.03. 16:30 | 11 |
| 2022.11.03. 16:45 | 11 |
| 2022.11.03. 17:00 | 11 |
| 2022.11.03. 17:15 | 11 |
| 2022.11.03. 17:30 | 11 |
| 2022.11.03. 17:45 | 11 |
| 2022.11.03. 18:00 | 11 |
| 2022.11.03. 18:15 | 11 |
| 2022.11.03. 18:30 | 11 |
| 2022.11.03. 18:45 | 11 |
| 2022.11.03. 19:00 | 11 |
| 2022.11.03. 19:15 | 11 |
| 2022.11.03. 19:30 | 11 |
| 2022.11.03. 19:45 | 11 |
| 2022.11.03. 20:00 | 11 |
| 2022.11.03. 20:15 | 11 |
| 2022.11.03. 20:30 | 11 |
| 2022.11.03. 20:45 | 11 |
| 2022.11.03. 21:00 | 11 |
| 2022.11.03. 21:15 | 11 |
| 2022.11.03. 21:30 | 11 |
| 2022.11.03. 21:45 | 11 |
| 2022.11.03. 22:00 | 11 |
| 2022.11.03. 22:15 | 11 |
| 2022.11.03. 22:30 | 11 |
| 2022.11.03. 22:45 | 11 |
| 2022.11.03. 23:00 | 11 |
| 2022.11.03. 23:15 | 11 |
| 2022.11.03. 23:30 | 11 |
| 2022.11.03. 23:45 | 11 |
| 2022.11.04. 00:00 | 11 |
| 2022.11.04. 00:15 | 11 |
| 2022.11.04. 00:30 | 11 |
| 2022.11.04. 00:45 | 11 |
| 2022.11.04. 01:00 | 11 |
| 2022.11.04. 01:15 | 11 |
| 2022.11.04. 01:30 | 11 |
| 2022.11.04. 01:45 | 11 |
| 2022.11.04. 02:00 | 11 |
| 2022.11.04. 02:15 | 11 |
| 2022.11.04. 02:30 | 11 |
| 2022.11.04. 02:45 | 11 |
| 2022.11.04. 03:00 | 11 |
| 2022.11.04. 03:15 | 11 |
| 2022.11.04. 03:30 | 11 |
| 2022.11.04. 03:45 | 11 |
| 2022.11.04. 04:00 | 11 |
| 2022.11.04. 04:15 | 11 |
| 2022.11.04. 04:30 | 11 |
| 2022.11.04. 04:45 | 11 |
| 2022.11.04. 05:00 | 11 |
| 2022.11.04. 05:15 | 11 |
| 2022.11.04. 05:30 | 11 |
| 2022.11.04. 05:45 | 11 |
| 2022.11.04. 06:00 | 11 |
| 2022.11.04. 06:15 | 11 |
| 2022.11.04. 06:30 | 11 |
| 2022.11.04. 06:45 | 11 |
| 2022.11.04. 07:00 | 11 |
| 2022.11.04. 07:15 | 11 |
| 2022.11.04. 07:30 | 11 |
| 2022.11.04. 07:45 | 11 |
| 2022.11.04. 08:00 | 11 |
| 2022.11.04. 08:15 | 11 |
| 2022.11.04. 08:30 | 11 |
| 2022.11.04. 08:45 | 11 |
| 2022.11.04. 09:00 | 11 |
| 2022.11.04. 09:15 | 11 |
| 2022.11.04. 09:30 | 11 |
| 2022.11.04. 09:45 | 11 |
| 2022.11.04. 10:00 | 11 |
| 2022.11.04. 10:15 | 11 |
| 2022.11.04. 10:30 | 11 |
| 2022.11.04. 10:45 | 11 |
| 2022.11.04. 11:00 | 11 |
| 2022.11.04. 11:15 | 11 |
| 2022.11.04. 11:30 | 11 |
| 2022.11.04. 11:45 | 11 |
| 2022.11.04. 12:00 | 11 |
| 2022.11.04. 12:15 | 11 |
| 2022.11.04. 12:30 | 11 |
| 2022.11.04. 12:45 | 11 |
| 2022.11.04. 13:00 | 11 |
| 2022.11.04. 13:15 | 11 |
| 2022.11.04. 13:30 | 11 |
| 2022.11.04. 13:45 | 11 |
| 2022.11.04. 14:00 | 11 |
| 2022.11.04. 14:15 | 11 |
| 2022.11.04. 14:30 | 11 |
| 2022.11.04. 14:45 | 11 |
| 2022.11.04. 15:00 | 11 |
| 2022.11.04. 15:15 | 11 |
| 2022.11.04. 15:30 | 11 |
| 2022.11.04. 15:45 | 11 |
| 2022.11.04. 16:00 | 11 |
| 2022.11.04. 16:15 | 11 |
| 2022.11.04. 16:30 | 11 |
| 2022.11.04. 16:45 | 11 |
| 2022.11.04. 17:00 | 11 |
| 2022.11.04. 17:15 | 11 |
| 2022.11.04. 17:30 | 11 |
| 2022.11.04. 17:45 | 11 |
| 2022.11.04. 18:00 | 11 |
| 2022.11.04. 18:15 | 11 |
| 2022.11.04. 18:30 | 11 |
| 2022.11.04. 18:45 | 11 |
| 2022.11.04. 19:00 | 11 |
| 2022.11.04. 19:15 | 11 |
| 2022.11.04. 19:30 | 11 |
| 2022.11.04. 19:45 | 11 |
| 2022.11.04. 20:00 | 11 |
| 2022.11.04. 20:15 | 11 |
| 2022.11.04. 20:30 | 11 |
| 2022.11.04. 20:45 | 11 |
| 2022.11.04. 21:00 | 11 |
| 2022.11.04. 21:15 | 11 |
| 2022.11.04. 21:30 | 11 |
| 2022.11.04. 21:45 | 11 |
| 2022.11.04. 22:00 | 11 |
| 2022.11.04. 22:15 | 11 |
| 2022.11.04. 22:30 | 11 |
| 2022.11.04. 22:45 | 11 |
| 2022.11.04. 23:00 | 11 |
| 2022.11.04. 23:15 | 11 |
| 2022.11.04. 23:30 | 11 |
| 2022.11.04. 23:45 | 11 |
| 2022.11.05. 00:00 | 17 |
| 2022.11.05. 00:15 | 17 |
| 2022.11.05. 00:30 | 17 |
| 2022.11.05. 00:45 | 17 |
| 2022.11.05. 01:00 | 17 |
| 2022.11.05. 01:15 | 17 |
| 2022.11.05. 01:30 | 17 |
| 2022.11.05. 01:45 | 17 |
| 2022.11.05. 02:00 | 17 |
| 2022.11.05. 02:15 | 17 |
| 2022.11.05. 02:30 | 17 |
| 2022.11.05. 02:45 | 17 |
| 2022.11.05. 03:00 | 17 |
| 2022.11.05. 03:15 | 17 |
| 2022.11.05. 03:30 | 17 |
| 2022.11.05. 03:45 | 17 |
| 2022.11.05. 04:00 | 17 |
| 2022.11.05. 04:15 | 17 |
| 2022.11.05. 04:30 | 17 |
| 2022.11.05. 04:45 | 17 |
| 2022.11.05. 05:00 | 17 |
| 2022.11.05. 05:15 | 17 |
| 2022.11.05. 05:30 | 17 |
| 2022.11.05. 05:45 | 17 |
| 2022.11.05. 06:00 | 17 |
| 2022.11.05. 06:15 | 17 |
| 2022.11.05. 06:30 | 17 |
| 2022.11.05. 06:45 | 17 |
| 2022.11.05. 07:00 | 17 |
| 2022.11.05. 07:15 | 17 |
| 2022.11.05. 07:30 | 17 |
| 2022.11.05. 07:45 | 17 |
| 2022.11.05. 08:00 | 17 |
| 2022.11.05. 08:15 | 17 |
| 2022.11.05. 08:30 | 17 |
| 2022.11.05. 08:45 | 17 |
| 2022.11.05. 09:00 | 17 |
| 2022.11.05. 09:15 | 17 |
| 2022.11.05. 09:30 | 17 |
| 2022.11.05. 09:45 | 17 |
| 2022.11.05. 10:00 | 17 |
| 2022.11.05. 10:15 | 17 |
| 2022.11.05. 10:30 | 17 |
| 2022.11.05. 10:45 | 17 |
| 2022.11.05. 11:00 | 17 |
| 2022.11.05. 11:15 | 17 |
| 2022.11.05. 11:30 | 17 |
| 2022.11.05. 11:45 | 17 |
| 2022.11.05. 12:00 | 17 |
| 2022.11.05. 12:15 | 17 |
| 2022.11.05. 12:30 | 17 |
| 2022.11.05. 12:45 | 17 |
| 2022.11.05. 13:00 | 17 |
| 2022.11.05. 13:15 | 17 |
| 2022.11.05. 13:30 | 17 |
| 2022.11.05. 13:45 | 17 |
| 2022.11.05. 14:00 | 17 |
| 2022.11.05. 14:15 | 17 |
| 2022.11.05. 14:30 | 17 |
| 2022.11.05. 14:45 | 17 |
| 2022.11.05. 15:00 | 17 |
| 2022.11.05. 15:15 | 17 |
| 2022.11.05. 15:30 | 17 |
| 2022.11.05. 15:45 | 17 |
| 2022.11.05. 16:00 | 17 |
| 2022.11.05. 16:15 | 17 |
| 2022.11.05. 16:30 | 17 |
| 2022.11.05. 16:45 | 17 |
| 2022.11.05. 17:00 | 17 |
| 2022.11.05. 17:15 | 17 |
| 2022.11.05. 17:30 | 17 |
| 2022.11.05. 17:45 | 17 |
| 2022.11.05. 18:00 | 17 |
| 2022.11.05. 18:15 | 17 |
| 2022.11.05. 18:30 | 17 |
| 2022.11.05. 18:45 | 17 |
| 2022.11.05. 19:00 | 17 |
| 2022.11.05. 19:15 | 17 |
| 2022.11.05. 19:30 | 17 |
| 2022.11.05. 19:45 | 17 |
| 2022.11.05. 20:00 | 17 |
| 2022.11.05. 20:15 | 17 |
| 2022.11.05. 20:30 | 17 |
| 2022.11.05. 20:45 | 17 |
| 2022.11.05. 21:00 | 17 |
| 2022.11.05. 21:15 | 17 |
| 2022.11.05. 21:30 | 17 |
| 2022.11.05. 21:45 | 17 |
| 2022.11.05. 22:00 | 17 |
| 2022.11.05. 22:15 | 17 |
| 2022.11.05. 22:30 | 17 |
| 2022.11.05. 22:45 | 17 |
| 2022.11.05. 23:00 | 17 |
| 2022.11.05. 23:15 | 17 |
| 2022.11.05. 23:30 | 17 |
| 2022.11.05. 23:45 | 17 |
| 2022.11.06. 00:00 | 17 |
| 2022.11.06. 00:15 | 17 |
| 2022.11.06. 00:30 | 17 |
| 2022.11.06. 00:45 | 17 |
| 2022.11.06. 01:00 | 17 |
| 2022.11.06. 01:15 | 17 |
| 2022.11.06. 01:30 | 17 |
| 2022.11.06. 01:45 | 17 |
| 2022.11.06. 02:00 | 17 |
| 2022.11.06. 02:15 | 17 |
| 2022.11.06. 02:30 | 17 |
| 2022.11.06. 02:45 | 17 |
| 2022.11.06. 03:00 | 17 |
| 2022.11.06. 03:15 | 17 |
| 2022.11.06. 03:30 | 17 |
| 2022.11.06. 03:45 | 17 |
| 2022.11.06. 04:00 | 17 |
| 2022.11.06. 04:15 | 17 |
| 2022.11.06. 04:30 | 17 |
| 2022.11.06. 04:45 | 17 |
| 2022.11.06. 05:00 | 17 |
| 2022.11.06. 05:15 | 17 |
| 2022.11.06. 05:30 | 17 |
| 2022.11.06. 05:45 | 17 |
| 2022.11.06. 06:00 | 17 |
| 2022.11.06. 06:15 | 17 |
| 2022.11.06. 06:30 | 17 |
| 2022.11.06. 06:45 | 17 |
| 2022.11.06. 07:00 | 17 |
| 2022.11.06. 07:15 | 17 |
| 2022.11.06. 07:30 | 17 |
| 2022.11.06. 07:45 | 17 |
| 2022.11.06. 08:00 | 17 |
| 2022.11.06. 08:15 | 17 |
| 2022.11.06. 08:30 | 17 |
| 2022.11.06. 08:45 | 17 |
| 2022.11.06. 09:00 | 17 |
| 2022.11.06. 09:15 | 17 |
| 2022.11.06. 09:30 | 17 |
| 2022.11.06. 09:45 | 17 |
| 2022.11.06. 10:00 | 17 |
| 2022.11.06. 10:15 | 17 |
| 2022.11.06. 10:30 | 17 |
| 2022.11.06. 10:45 | 17 |
| 2022.11.06. 11:00 | 17 |
| 2022.11.06. 11:15 | 17 |
| 2022.11.06. 11:30 | 17 |
| 2022.11.06. 11:45 | 17 |
| 2022.11.06. 12:00 | 17 |
| 2022.11.06. 12:15 | 17 |
| 2022.11.06. 12:30 | 17 |
| 2022.11.06. 12:45 | 17 |
| 2022.11.06. 13:00 | 17 |
| 2022.11.06. 13:15 | 17 |
| 2022.11.06. 13:30 | 17 |
| 2022.11.06. 13:45 | 17 |
| 2022.11.06. 14:00 | 17 |
| 2022.11.06. 14:15 | 17 |
| 2022.11.06. 14:30 | 17 |
| 2022.11.06. 14:45 | 17 |
| 2022.11.06. 15:00 | 17 |
| 2022.11.06. 15:15 | 17 |
| 2022.11.06. 15:30 | 17 |
| 2022.11.06. 15:45 | 17 |
| 2022.11.06. 16:00 | 17 |
| 2022.11.06. 16:15 | 17 |
| 2022.11.06. 16:30 | 17 |
| 2022.11.06. 16:45 | 17 |
| 2022.11.06. 17:00 | 17 |
| 2022.11.06. 17:15 | 17 |
| 2022.11.06. 17:30 | 17 |
| 2022.11.06. 17:45 | 17 |
| 2022.11.06. 18:00 | 17 |
| 2022.11.06. 18:15 | 17 |
| 2022.11.06. 18:30 | 17 |
| 2022.11.06. 18:45 | 17 |
| 2022.11.06. 19:00 | 17 |
| 2022.11.06. 19:15 | 17 |
| 2022.11.06. 19:30 | 17 |
| 2022.11.06. 19:45 | 17 |
| 2022.11.06. 20:00 | 17 |
| 2022.11.06. 20:15 | 17 |
| 2022.11.06. 20:30 | 17 |
| 2022.11.06. 20:45 | 17 |
| 2022.11.06. 21:00 | 17 |
| 2022.11.06. 21:15 | 17 |
| 2022.11.06. 21:30 | 17 |
| 2022.11.06. 21:45 | 17 |
| 2022.11.06. 22:00 | 17 |
| 2022.11.06. 22:15 | 17 |
| 2022.11.06. 22:30 | 17 |
| 2022.11.06. 22:45 | 17 |
| 2022.11.06. 23:00 | 17 |
| 2022.11.06. 23:15 | 17 |
| 2022.11.06. 23:30 | 17 |
| 2022.11.06. 23:45 | 17 |
| 2022.11.07. 00:00 | 17 |
| 2022.11.07. 00:15 | 17 |
| 2022.11.07. 00:30 | 17 |
| 2022.11.07. 00:45 | 17 |
| 2022.11.07. 01:00 | 17 |
| 2022.11.07. 01:15 | 17 |
| 2022.11.07. 01:30 | 17 |
| 2022.11.07. 01:45 | 17 |
| 2022.11.07. 02:00 | 17 |
| 2022.11.07. 02:15 | 17 |
| 2022.11.07. 02:30 | 17 |
| 2022.11.07. 02:45 | 17 |
| 2022.11.07. 03:00 | 17 |
| 2022.11.07. 03:15 | 17 |
| 2022.11.07. 03:30 | 17 |
| 2022.11.07. 03:45 | 17 |
| 2022.11.07. 04:00 | 17 |
| 2022.11.07. 04:15 | 17 |
| 2022.11.07. 04:30 | 17 |
| 2022.11.07. 04:45 | 17 |
| 2022.11.07. 05:00 | 17 |
| 2022.11.07. 05:15 | 17 |
| 2022.11.07. 05:30 | 17 |
| 2022.11.07. 05:45 | 17 |
| 2022.11.07. 06:00 | 17 |
| 2022.11.07. 06:15 | 17 |
| 2022.11.07. 06:30 | 17 |
| 2022.11.07. 06:45 | 17 |
| 2022.11.07. 07:00 | 17 |
| 2022.11.07. 07:15 | 17 |
| 2022.11.07. 07:30 | 17 |
| 2022.11.07. 07:45 | 17 |
| 2022.11.07. 08:00 | 17 |
| 2022.11.07. 08:15 | 17 |
| 2022.11.07. 08:30 | 17 |
| 2022.11.07. 08:45 | 17 |
| 2022.11.07. 09:00 | 17 |
| 2022.11.07. 09:15 | 17 |
| 2022.11.07. 09:30 | 17 |
| 2022.11.07. 09:45 | 17 |
| 2022.11.07. 10:00 | 17 |
| 2022.11.07. 10:15 | 17 |
| 2022.11.07. 10:30 | 17 |
| 2022.11.07. 10:45 | 17 |
| 2022.11.07. 11:00 | 17 |
| 2022.11.07. 11:15 | 17 |
| 2022.11.07. 11:30 | 17 |
| 2022.11.07. 11:45 | 17 |
| 2022.11.07. 12:00 | 17 |
| 2022.11.07. 12:15 | 17 |
| 2022.11.07. 12:30 | 17 |
| 2022.11.07. 12:45 | 17 |
| 2022.11.07. 13:00 | 17 |
| 2022.11.07. 13:15 | 17 |
| 2022.11.07. 13:30 | 17 |
| 2022.11.07. 13:45 | 17 |
| 2022.11.07. 14:00 | 17 |
| 2022.11.07. 14:15 | 17 |
| 2022.11.07. 14:30 | 17 |
| 2022.11.07. 14:45 | 17 |
| 2022.11.07. 15:00 | 17 |
| 2022.11.07. 15:15 | 17 |
| 2022.11.07. 15:30 | 17 |
| 2022.11.07. 15:45 | 17 |
| 2022.11.07. 16:00 | 17 |
| 2022.11.07. 16:15 | 17 |
| 2022.11.07. 16:30 | 17 |
| 2022.11.07. 16:45 | 17 |
| 2022.11.07. 17:00 | 17 |
| 2022.11.07. 17:15 | 17 |
| 2022.11.07. 17:30 | 17 |
| 2022.11.07. 17:45 | 17 |
| 2022.11.07. 18:00 | 17 |
| 2022.11.07. 18:15 | 17 |
| 2022.11.07. 18:30 | 17 |
| 2022.11.07. 18:45 | 17 |
| 2022.11.07. 19:00 | 17 |
| 2022.11.07. 19:15 | 17 |
| 2022.11.07. 19:30 | 17 |
| 2022.11.07. 19:45 | 17 |
| 2022.11.07. 20:00 | 17 |
| 2022.11.07. 20:15 | 17 |
| 2022.11.07. 20:30 | 17 |
| 2022.11.07. 20:45 | 17 |
| 2022.11.07. 21:00 | 17 |
| 2022.11.07. 21:15 | 17 |
| 2022.11.07. 21:30 | 17 |
| 2022.11.07. 21:45 | 17 |
| 2022.11.07. 22:00 | 17 |
| 2022.11.07. 22:15 | 17 |
| 2022.11.07. 22:30 | 17 |
| 2022.11.07. 22:45 | 17 |
| 2022.11.07. 23:00 | 17 |
| 2022.11.07. 23:15 | 17 |
| 2022.11.07. 23:30 | 17 |
| 2022.11.07. 23:45 | 17 |
| 2022.11.08. 00:00 | 17 |
| 2022.11.08. 00:15 | 17 |
| 2022.11.08. 00:30 | 17 |
| 2022.11.08. 00:45 | 17 |
| 2022.11.08. 01:00 | 17 |
| 2022.11.08. 01:15 | 17 |
| 2022.11.08. 01:30 | 17 |
| 2022.11.08. 01:45 | 17 |
| 2022.11.08. 02:00 | 17 |
| 2022.11.08. 02:15 | 17 |
| 2022.11.08. 02:30 | 17 |
| 2022.11.08. 02:45 | 17 |
| 2022.11.08. 03:00 | 17 |
| 2022.11.08. 03:15 | 17 |
| 2022.11.08. 03:30 | 17 |
| 2022.11.08. 03:45 | 17 |
| 2022.11.08. 04:00 | 17 |
| 2022.11.08. 04:15 | 17 |
| 2022.11.08. 04:30 | 17 |
| 2022.11.08. 04:45 | 17 |
| 2022.11.08. 05:00 | 17 |
| 2022.11.08. 05:15 | 17 |
| 2022.11.08. 05:30 | 17 |
| 2022.11.08. 05:45 | 17 |
| 2022.11.08. 06:00 | 17 |
| 2022.11.08. 06:15 | 17 |
| 2022.11.08. 06:30 | 17 |
| 2022.11.08. 06:45 | 17 |
| 2022.11.08. 07:00 | 17 |
| 2022.11.08. 07:15 | 17 |
| 2022.11.08. 07:30 | 17 |
| 2022.11.08. 07:45 | 17 |
| 2022.11.08. 08:00 | 17 |
| 2022.11.08. 08:15 | 17 |
| 2022.11.08. 08:30 | 17 |
| 2022.11.08. 08:45 | 17 |
| 2022.11.08. 09:00 | 17 |
| 2022.11.08. 09:15 | 17 |
| 2022.11.08. 09:30 | 17 |
| 2022.11.08. 09:45 | 17 |
| 2022.11.08. 10:00 | 17 |
| 2022.11.08. 10:15 | 17 |
| 2022.11.08. 10:30 | 17 |
| 2022.11.08. 10:45 | 17 |
| 2022.11.08. 11:00 | 17 |
| 2022.11.08. 11:15 | 17 |
| 2022.11.08. 11:30 | 17 |
| 2022.11.08. 11:45 | 17 |
| 2022.11.08. 12:00 | 17 |
| 2022.11.08. 12:15 | 17 |
| 2022.11.08. 12:30 | 17 |
| 2022.11.08. 12:45 | 17 |
| 2022.11.08. 13:00 | 17 |
| 2022.11.08. 13:15 | 17 |
| 2022.11.08. 13:30 | 17 |
| 2022.11.08. 13:45 | 17 |
| 2022.11.08. 14:00 | 17 |
| 2022.11.08. 14:15 | 17 |
| 2022.11.08. 14:30 | 17 |
| 2022.11.08. 14:45 | 17 |
| 2022.11.08. 15:00 | 17 |
| 2022.11.08. 15:15 | 17 |
| 2022.11.08. 15:30 | 17 |
| 2022.11.08. 15:45 | 17 |
| 2022.11.08. 16:00 | 17 |
| 2022.11.08. 16:15 | 17 |
| 2022.11.08. 16:30 | 17 |
| 2022.11.08. 16:45 | 17 |
| 2022.11.08. 17:00 | 17 |
| 2022.11.08. 17:15 | 17 |
| 2022.11.08. 17:30 | 17 |
| 2022.11.08. 17:45 | 17 |
| 2022.11.08. 18:00 | 17 |
| 2022.11.08. 18:15 | 17 |
| 2022.11.08. 18:30 | 17 |
| 2022.11.08. 18:45 | 17 |
| 2022.11.08. 19:00 | 17 |
| 2022.11.08. 19:15 | 17 |
| 2022.11.08. 19:30 | 17 |
| 2022.11.08. 19:45 | 17 |
| 2022.11.08. 20:00 | 17 |
| 2022.11.08. 20:15 | 17 |
| 2022.11.08. 20:30 | 17 |
| 2022.11.08. 20:45 | 17 |
| 2022.11.08. 21:00 | 17 |
| 2022.11.08. 21:15 | 17 |
| 2022.11.08. 21:30 | 17 |
| 2022.11.08. 21:45 | 17 |
| 2022.11.08. 22:00 | 17 |
| 2022.11.08. 22:15 | 17 |
| 2022.11.08. 22:30 | 17 |
| 2022.11.08. 22:45 | 17 |
| 2022.11.08. 23:00 | 17 |
| 2022.11.08. 23:15 | 17 |
| 2022.11.08. 23:30 | 17 |
| 2022.11.08. 23:45 | 17 |
| 2022.11.09. 00:00 | 17 |
| 2022.11.09. 00:15 | 17 |
| 2022.11.09. 00:30 | 17 |
| 2022.11.09. 00:45 | 17 |
| 2022.11.09. 01:00 | 17 |
| 2022.11.09. 01:15 | 17 |
| 2022.11.09. 01:30 | 17 |
| 2022.11.09. 01:45 | 17 |
| 2022.11.09. 02:00 | 17 |
| 2022.11.09. 02:15 | 17 |
| 2022.11.09. 02:30 | 17 |
| 2022.11.09. 02:45 | 17 |
| 2022.11.09. 03:00 | 17 |
| 2022.11.09. 03:15 | 17 |
| 2022.11.09. 03:30 | 17 |
| 2022.11.09. 03:45 | 17 |
| 2022.11.09. 04:00 | 17 |
| 2022.11.09. 04:15 | 17 |
| 2022.11.09. 04:30 | 17 |
| 2022.11.09. 04:45 | 17 |
| 2022.11.09. 05:00 | 17 |
| 2022.11.09. 05:15 | 17 |
| 2022.11.09. 05:30 | 17 |
| 2022.11.09. 05:45 | 17 |
| 2022.11.09. 06:00 | 17 |
| 2022.11.09. 06:15 | 17 |
| 2022.11.09. 06:30 | 17 |
| 2022.11.09. 06:45 | 17 |
| 2022.11.09. 07:00 | 17 |
| 2022.11.09. 07:15 | 17 |
| 2022.11.09. 07:30 | 17 |
| 2022.11.09. 07:45 | 17 |
| 2022.11.09. 08:00 | 17 |
| 2022.11.09. 08:15 | 17 |
| 2022.11.09. 08:30 | 17 |
| 2022.11.09. 08:45 | 17 |
| 2022.11.09. 09:00 | 17 |
| 2022.11.09. 09:15 | 17 |
| 2022.11.09. 09:30 | 17 |
| 2022.11.09. 09:45 | 17 |
| 2022.11.09. 10:00 | 17 |
| 2022.11.09. 10:15 | 17 |
| 2022.11.09. 10:30 | 17 |
| 2022.11.09. 10:45 | 17 |
| 2022.11.09. 11:00 | 17 |
| 2022.11.09. 11:15 | 17 |
| 2022.11.09. 11:30 | 17 |
| 2022.11.09. 11:45 | 17 |
| 2022.11.09. 12:00 | 17 |
| 2022.11.09. 12:15 | 17 |
| 2022.11.09. 12:30 | 17 |
| 2022.11.09. 12:45 | 17 |
| 2022.11.09. 13:00 | 17 |
| 2022.11.09. 13:15 | 17 |
| 2022.11.09. 13:30 | 17 |
| 2022.11.09. 13:45 | 17 |
| 2022.11.09. 14:00 | 17 |
| 2022.11.09. 14:15 | 17 |
| 2022.11.09. 14:30 | 17 |
| 2022.11.09. 14:45 | 17 |
| 2022.11.09. 15:00 | 17 |
| 2022.11.09. 15:15 | 17 |
| 2022.11.09. 15:30 | 17 |
| 2022.11.09. 15:45 | 17 |
| 2022.11.09. 16:00 | 17 |
| 2022.11.09. 16:15 | 17 |
| 2022.11.09. 16:30 | 17 |
| 2022.11.09. 16:45 | 17 |
| 2022.11.09. 17:00 | 17 |
| 2022.11.09. 17:15 | 17 |
| 2022.11.09. 17:30 | 17 |
| 2022.11.09. 17:45 | 17 |
| 2022.11.09. 18:00 | 17 |
| 2022.11.09. 18:15 | 17 |
| 2022.11.09. 18:30 | 17 |
| 2022.11.09. 18:45 | 17 |
| 2022.11.09. 19:00 | 17 |
| 2022.11.09. 19:15 | 17 |
| 2022.11.09. 19:30 | 17 |
| 2022.11.09. 19:45 | 17 |
| 2022.11.09. 20:00 | 17 |
| 2022.11.09. 20:15 | 17 |
| 2022.11.09. 20:30 | 17 |
| 2022.11.09. 20:45 | 17 |
| 2022.11.09. 21:00 | 17 |
| 2022.11.09. 21:15 | 17 |
| 2022.11.09. 21:30 | 17 |
| 2022.11.09. 21:45 | 17 |
| 2022.11.09. 22:00 | 17 |
| 2022.11.09. 22:15 | 17 |
| 2022.11.09. 22:30 | 17 |
| 2022.11.09. 22:45 | 17 |
| 2022.11.09. 23:00 | 17 |
| 2022.11.09. 23:15 | 17 |
| 2022.11.09. 23:30 | 17 |
| 2022.11.09. 23:45 | 17 |
| 2022.11.10. 00:00 | 17 |
| 2022.11.10. 00:15 | 17 |
| 2022.11.10. 00:30 | 17 |
| 2022.11.10. 00:45 | 17 |
| 2022.11.10. 01:00 | 17 |
| 2022.11.10. 01:15 | 17 |
| 2022.11.10. 01:30 | 17 |
| 2022.11.10. 01:45 | 17 |
| 2022.11.10. 02:00 | 17 |
| 2022.11.10. 02:15 | 17 |
| 2022.11.10. 02:30 | 17 |
| 2022.11.10. 02:45 | 17 |
| 2022.11.10. 03:00 | 17 |
| 2022.11.10. 03:15 | 17 |
| 2022.11.10. 03:30 | 17 |
| 2022.11.10. 03:45 | 17 |
| 2022.11.10. 04:00 | 17 |
| 2022.11.10. 04:15 | 17 |
| 2022.11.10. 04:30 | 17 |
| 2022.11.10. 04:45 | 17 |
| 2022.11.10. 05:00 | 17 |
| 2022.11.10. 05:15 | 17 |
| 2022.11.10. 05:30 | 17 |
| 2022.11.10. 05:45 | 17 |
| 2022.11.10. 06:00 | 17 |
| 2022.11.10. 06:15 | 17 |
| 2022.11.10. 06:30 | 17 |
| 2022.11.10. 06:45 | 17 |
| 2022.11.10. 07:00 | 17 |
| 2022.11.10. 07:15 | 17 |
| 2022.11.10. 07:30 | 17 |
| 2022.11.10. 07:45 | 17 |
| 2022.11.10. 08:00 | 17 |
| 2022.11.10. 08:15 | 17 |
| 2022.11.10. 08:30 | 17 |
| 2022.11.10. 08:45 | 17 |
| 2022.11.10. 09:00 | 17 |
| 2022.11.10. 09:15 | 17 |
| 2022.11.10. 09:30 | 17 |
| 2022.11.10. 09:45 | 17 |
| 2022.11.10. 10:00 | 17 |
| 2022.11.10. 10:15 | 17 |
| 2022.11.10. 10:30 | 17 |
| 2022.11.10. 10:45 | 17 |
| 2022.11.10. 11:00 | 17 |
| 2022.11.10. 11:15 | 17 |
| 2022.11.10. 11:30 | 17 |
| 2022.11.10. 11:45 | 17 |
| 2022.11.10. 12:00 | 17 |
| 2022.11.10. 12:15 | 17 |
| 2022.11.10. 12:30 | 17 |
| 2022.11.10. 12:45 | 17 |
| 2022.11.10. 13:00 | 17 |
| 2022.11.10. 13:15 | 17 |
| 2022.11.10. 13:30 | 17 |
| 2022.11.10. 13:45 | 17 |
| 2022.11.10. 14:00 | 17 |
| 2022.11.10. 14:15 | 17 |
| 2022.11.10. 14:30 | 17 |
| 2022.11.10. 14:45 | 17 |
| 2022.11.10. 15:00 | 17 |
| 2022.11.10. 15:15 | 17 |
| 2022.11.10. 15:30 | 17 |
| 2022.11.10. 15:45 | 17 |
| 2022.11.10. 16:00 | 17 |
| 2022.11.10. 16:15 | 17 |
| 2022.11.10. 16:30 | 17 |
| 2022.11.10. 16:45 | 17 |
| 2022.11.10. 17:00 | 17 |
| 2022.11.10. 17:15 | 17 |
| 2022.11.10. 17:30 | 17 |
| 2022.11.10. 17:45 | 17 |
| 2022.11.10. 18:00 | 17 |
| 2022.11.10. 18:15 | 17 |
| 2022.11.10. 18:30 | 17 |
| 2022.11.10. 18:45 | 17 |
| 2022.11.10. 19:00 | 17 |
| 2022.11.10. 19:15 | 17 |
| 2022.11.10. 19:30 | 17 |
| 2022.11.10. 19:45 | 17 |
| 2022.11.10. 20:00 | 17 |
| 2022.11.10. 20:15 | 17 |
| 2022.11.10. 20:30 | 17 |
| 2022.11.10. 20:45 | 17 |
| 2022.11.10. 21:00 | 17 |
| 2022.11.10. 21:15 | 17 |
| 2022.11.10. 21:30 | 17 |
| 2022.11.10. 21:45 | 17 |
| 2022.11.10. 22:00 | 17 |
| 2022.11.10. 22:15 | 17 |
| 2022.11.10. 22:30 | 17 |
| 2022.11.10. 22:45 | 17 |
| 2022.11.10. 23:00 | 17 |
| 2022.11.10. 23:15 | 17 |
| 2022.11.10. 23:30 | 17 |
| 2022.11.10. 23:45 | 17 |
| 2022.11.11. 00:00 | 17 |
| 2022.11.11. 00:15 | 17 |
| 2022.11.11. 00:30 | 17 |
| 2022.11.11. 00:45 | 17 |
| 2022.11.11. 01:00 | 17 |
| 2022.11.11. 01:15 | 17 |
| 2022.11.11. 01:30 | 17 |
| 2022.11.11. 01:45 | 17 |
| 2022.11.11. 02:00 | 17 |
| 2022.11.11. 02:15 | 17 |
| 2022.11.11. 02:30 | 17 |
| 2022.11.11. 02:45 | 17 |
| 2022.11.11. 03:00 | 17 |
| 2022.11.11. 03:15 | 17 |
| 2022.11.11. 03:30 | 17 |
| 2022.11.11. 03:45 | 17 |
| 2022.11.11. 04:00 | 17 |
| 2022.11.11. 04:15 | 17 |
| 2022.11.11. 04:30 | 17 |
| 2022.11.11. 04:45 | 17 |
| 2022.11.11. 05:00 | 17 |
| 2022.11.11. 05:15 | 17 |
| 2022.11.11. 05:30 | 17 |
| 2022.11.11. 05:45 | 17 |
| 2022.11.11. 06:00 | 17 |
| 2022.11.11. 06:15 | 17 |
| 2022.11.11. 06:30 | 17 |
| 2022.11.11. 06:45 | 17 |
| 2022.11.11. 07:00 | 17 |
| 2022.11.11. 07:15 | 17 |
| 2022.11.11. 07:30 | 17 |
| 2022.11.11. 07:45 | 17 |
| 2022.11.11. 08:00 | 17 |
| 2022.11.11. 08:15 | 17 |
| 2022.11.11. 08:30 | 17 |
| 2022.11.11. 08:45 | 17 |
| 2022.11.11. 09:00 | 17 |
| 2022.11.11. 09:15 | 17 |
| 2022.11.11. 09:30 | 17 |
| 2022.11.11. 09:45 | 17 |
| 2022.11.11. 10:00 | 17 |
| 2022.11.11. 10:15 | 17 |
| 2022.11.11. 10:30 | 17 |
| 2022.11.11. 10:45 | 17 |
| 2022.11.11. 11:00 | 17 |
| 2022.11.11. 11:15 | 17 |
| 2022.11.11. 11:30 | 17 |
| 2022.11.11. 11:45 | 17 |
| 2022.11.11. 12:00 | 17 |
| 2022.11.11. 12:15 | 17 |
| 2022.11.11. 12:30 | 17 |
| 2022.11.11. 12:45 | 17 |
| 2022.11.11. 13:00 | 17 |
| 2022.11.11. 13:15 | 17 |
| 2022.11.11. 13:30 | 17 |
| 2022.11.11. 13:45 | 17 |
| 2022.11.11. 14:00 | 17 |
| 2022.11.11. 14:15 | 17 |
| 2022.11.11. 14:30 | 17 |
| 2022.11.11. 14:45 | 17 |
| 2022.11.11. 15:00 | 17 |
| 2022.11.11. 15:15 | 17 |
| 2022.11.11. 15:30 | 17 |
| 2022.11.11. 15:45 | 17 |
| 2022.11.11. 16:00 | 17 |
| 2022.11.11. 16:15 | 17 |
| 2022.11.11. 16:30 | 17 |
| 2022.11.11. 16:45 | 17 |
| 2022.11.11. 17:00 | 17 |
| 2022.11.11. 17:15 | 17 |
| 2022.11.11. 17:30 | 17 |
| 2022.11.11. 17:45 | 17 |
| 2022.11.11. 18:00 | 17 |
| 2022.11.11. 18:15 | 17 |
| 2022.11.11. 18:30 | 17 |
| 2022.11.11. 18:45 | 17 |
| 2022.11.11. 19:00 | 17 |
| 2022.11.11. 19:15 | 17 |
| 2022.11.11. 19:30 | 17 |
| 2022.11.11. 19:45 | 17 |
| 2022.11.11. 20:00 | 17 |
| 2022.11.11. 20:15 | 17 |
| 2022.11.11. 20:30 | 17 |
| 2022.11.11. 20:45 | 17 |
| 2022.11.11. 21:00 | 17 |
| 2022.11.11. 21:15 | 17 |
| 2022.11.11. 21:30 | 17 |
| 2022.11.11. 21:45 | 17 |
| 2022.11.11. 22:00 | 17 |
| 2022.11.11. 22:15 | 17 |
| 2022.11.11. 22:30 | 17 |
| 2022.11.11. 22:45 | 17 |
| 2022.11.11. 23:00 | 17 |
| 2022.11.11. 23:15 | 17 |
| 2022.11.11. 23:30 | 17 |
| 2022.11.11. 23:45 | 17 |
| 2022.11.12. 00:00 | 17 |
| 2022.11.12. 00:15 | 17 |
| 2022.11.12. 00:30 | 17 |
| 2022.11.12. 00:45 | 17 |
| 2022.11.12. 01:00 | 17 |
| 2022.11.12. 01:15 | 17 |
| 2022.11.12. 01:30 | 17 |
| 2022.11.12. 01:45 | 17 |
| 2022.11.12. 02:00 | 17 |
| 2022.11.12. 02:15 | 17 |
| 2022.11.12. 02:30 | 17 |
| 2022.11.12. 02:45 | 17 |
| 2022.11.12. 03:00 | 17 |
| 2022.11.12. 03:15 | 17 |
| 2022.11.12. 03:30 | 17 |
| 2022.11.12. 03:45 | 17 |
| 2022.11.12. 04:00 | 17 |
| 2022.11.12. 04:15 | 17 |
| 2022.11.12. 04:30 | 17 |
| 2022.11.12. 04:45 | 17 |
| 2022.11.12. 05:00 | 17 |
| 2022.11.12. 05:15 | 17 |
| 2022.11.12. 05:30 | 17 |
| 2022.11.12. 05:45 | 17 |
| 2022.11.12. 06:00 | 17 |
| 2022.11.12. 06:15 | 17 |
| 2022.11.12. 06:30 | 17 |
| 2022.11.12. 06:45 | 17 |
| 2022.11.12. 07:00 | 17 |
| 2022.11.12. 07:15 | 17 |
| 2022.11.12. 07:30 | 17 |
| 2022.11.12. 07:45 | 17 |
| 2022.11.12. 08:00 | 17 |
| 2022.11.12. 08:15 | 17 |
| 2022.11.12. 08:30 | 17 |
| 2022.11.12. 08:45 | 17 |
| 2022.11.12. 09:00 | 17 |
| 2022.11.12. 09:15 | 17 |
| 2022.11.12. 09:30 | 17 |
| 2022.11.12. 09:45 | 17 |
| 2022.11.12. 10:00 | 17 |
| 2022.11.12. 10:15 | 17 |
| 2022.11.12. 10:30 | 17 |
| 2022.11.12. 10:45 | 17 |
| 2022.11.12. 11:00 | 17 |
| 2022.11.12. 11:15 | 17 |
| 2022.11.12. 11:30 | 17 |
| 2022.11.12. 11:45 | 17 |
| 2022.11.12. 12:00 | 17 |
| 2022.11.12. 12:15 | 17 |
| 2022.11.12. 12:30 | 17 |
| 2022.11.12. 12:45 | 17 |
| 2022.11.12. 13:00 | 17 |
| 2022.11.12. 13:15 | 17 |
| 2022.11.12. 13:30 | 17 |
| 2022.11.12. 13:45 | 17 |
| 2022.11.12. 14:00 | 17 |
| 2022.11.12. 14:15 | 17 |
| 2022.11.12. 14:30 | 17 |
| 2022.11.12. 14:45 | 17 |
| 2022.11.12. 15:00 | 17 |
| 2022.11.12. 15:15 | 17 |
| 2022.11.12. 15:30 | 17 |
| 2022.11.12. 15:45 | 17 |
| 2022.11.12. 16:00 | 17 |
| 2022.11.12. 16:15 | 17 |
| 2022.11.12. 16:30 | 17 |
| 2022.11.12. 16:45 | 17 |
| 2022.11.12. 17:00 | 17 |
| 2022.11.12. 17:15 | 17 |
| 2022.11.12. 17:30 | 17 |
| 2022.11.12. 17:45 | 17 |
| 2022.11.12. 18:00 | 17 |
| 2022.11.12. 18:15 | 17 |
| 2022.11.12. 18:30 | 17 |
| 2022.11.12. 18:45 | 17 |
| 2022.11.12. 19:00 | 17 |
| 2022.11.12. 19:15 | 17 |
| 2022.11.12. 19:30 | 17 |
| 2022.11.12. 19:45 | 17 |
| 2022.11.12. 20:00 | 17 |
| 2022.11.12. 20:15 | 17 |
| 2022.11.12. 20:30 | 17 |
| 2022.11.12. 20:45 | 17 |
| 2022.11.12. 21:00 | 17 |
| 2022.11.12. 21:15 | 17 |
| 2022.11.12. 21:30 | 17 |
| 2022.11.12. 21:45 | 17 |
| 2022.11.12. 22:00 | 17 |
| 2022.11.12. 22:15 | 17 |
| 2022.11.12. 22:30 | 17 |
| 2022.11.12. 22:45 | 17 |
| 2022.11.12. 23:00 | 17 |
| 2022.11.12. 23:15 | 17 |
| 2022.11.12. 23:30 | 17 |
| 2022.11.12. 23:45 | 17 |
| 2022.11.13. 00:00 | 17 |
| 2022.11.13. 00:15 | 17 |
| 2022.11.13. 00:30 | 17 |
| 2022.11.13. 00:45 | 17 |
| 2022.11.13. 01:00 | 17 |
| 2022.11.13. 01:15 | 17 |
| 2022.11.13. 01:30 | 17 |
| 2022.11.13. 01:45 | 17 |
| 2022.11.13. 02:00 | 17 |
| 2022.11.13. 02:15 | 17 |
| 2022.11.13. 02:30 | 17 |
| 2022.11.13. 02:45 | 17 |
| 2022.11.13. 03:00 | 17 |
| 2022.11.13. 03:15 | 17 |
| 2022.11.13. 03:30 | 17 |
| 2022.11.13. 03:45 | 17 |
| 2022.11.13. 04:00 | 17 |
| 2022.11.13. 04:15 | 17 |
| 2022.11.13. 04:30 | 17 |
| 2022.11.13. 04:45 | 17 |
| 2022.11.13. 05:00 | 17 |
| 2022.11.13. 05:15 | 17 |
| 2022.11.13. 05:30 | 17 |
| 2022.11.13. 05:45 | 17 |
| 2022.11.13. 06:00 | 17 |
| 2022.11.13. 06:15 | 17 |
| 2022.11.13. 06:30 | 17 |
| 2022.11.13. 06:45 | 17 |
| 2022.11.13. 07:00 | 17 |
| 2022.11.13. 07:15 | 17 |
| 2022.11.13. 07:30 | 17 |
| 2022.11.13. 07:45 | 17 |
| 2022.11.13. 08:00 | 17 |
| 2022.11.13. 08:15 | 17 |
| 2022.11.13. 08:30 | 17 |
| 2022.11.13. 08:45 | 17 |
| 2022.11.13. 09:00 | 17 |
| 2022.11.13. 09:15 | 17 |
| 2022.11.13. 09:30 | 17 |
| 2022.11.13. 09:45 | 17 |
| 2022.11.13. 10:00 | 17 |
| 2022.11.13. 10:15 | 17 |
| 2022.11.13. 10:30 | 17 |
| 2022.11.13. 10:45 | 17 |
| 2022.11.13. 11:00 | 17 |
| 2022.11.13. 11:15 | 17 |
| 2022.11.13. 11:30 | 17 |
| 2022.11.13. 11:45 | 17 |
| 2022.11.13. 12:00 | 17 |
| 2022.11.13. 12:15 | 17 |
| 2022.11.13. 12:30 | 17 |
| 2022.11.13. 12:45 | 17 |
| 2022.11.13. 13:00 | 17 |
| 2022.11.13. 13:15 | 17 |
| 2022.11.13. 13:30 | 17 |
| 2022.11.13. 13:45 | 17 |
| 2022.11.13. 14:00 | 17 |
| 2022.11.13. 14:15 | 17 |
| 2022.11.13. 14:30 | 17 |
| 2022.11.13. 14:45 | 17 |
| 2022.11.13. 15:00 | 17 |
| 2022.11.13. 15:15 | 17 |
| 2022.11.13. 15:30 | 17 |
| 2022.11.13. 15:45 | 17 |
| 2022.11.13. 16:00 | 17 |
| 2022.11.13. 16:15 | 17 |
| 2022.11.13. 16:30 | 17 |
| 2022.11.13. 16:45 | 17 |
| 2022.11.13. 17:00 | 17 |
| 2022.11.13. 17:15 | 17 |
| 2022.11.13. 17:30 | 17 |
| 2022.11.13. 17:45 | 17 |
| 2022.11.13. 18:00 | 17 |
| 2022.11.13. 18:15 | 17 |
| 2022.11.13. 18:30 | 17 |
| 2022.11.13. 18:45 | 17 |
| 2022.11.13. 19:00 | 17 |
| 2022.11.13. 19:15 | 17 |
| 2022.11.13. 19:30 | 17 |
| 2022.11.13. 19:45 | 17 |
| 2022.11.13. 20:00 | 17 |
| 2022.11.13. 20:15 | 17 |
| 2022.11.13. 20:30 | 17 |
| 2022.11.13. 20:45 | 17 |
| 2022.11.13. 21:00 | 17 |
| 2022.11.13. 21:15 | 17 |
| 2022.11.13. 21:30 | 17 |
| 2022.11.13. 21:45 | 17 |
| 2022.11.13. 22:00 | 17 |
| 2022.11.13. 22:15 | 17 |
| 2022.11.13. 22:30 | 17 |
| 2022.11.13. 22:45 | 17 |
| 2022.11.13. 23:00 | 17 |
| 2022.11.13. 23:15 | 17 |
| 2022.11.13. 23:30 | 17 |
| 2022.11.13. 23:45 | 17 |
| 2022.11.14. 00:00 | 17 |
| 2022.11.14. 00:15 | 17 |
| 2022.11.14. 00:30 | 17 |
| 2022.11.14. 00:45 | 17 |
| 2022.11.14. 01:00 | 17 |
| 2022.11.14. 01:15 | 17 |
| 2022.11.14. 01:30 | 17 |
| 2022.11.14. 01:45 | 17 |
| 2022.11.14. 02:00 | 17 |
| 2022.11.14. 02:15 | 17 |
| 2022.11.14. 02:30 | 17 |
| 2022.11.14. 02:45 | 17 |
| 2022.11.14. 03:00 | 17 |
| 2022.11.14. 03:15 | 17 |
| 2022.11.14. 03:30 | 17 |
| 2022.11.14. 03:45 | 17 |
| 2022.11.14. 04:00 | 17 |
| 2022.11.14. 04:15 | 17 |
| 2022.11.14. 04:30 | 17 |
| 2022.11.14. 04:45 | 17 |
| 2022.11.14. 05:00 | 17 |
| 2022.11.14. 05:15 | 17 |
| 2022.11.14. 05:30 | 17 |
| 2022.11.14. 05:45 | 17 |
| 2022.11.14. 06:00 | 17 |
| 2022.11.14. 06:15 | 17 |
| 2022.11.14. 06:30 | 17 |
| 2022.11.14. 06:45 | 17 |
| 2022.11.14. 07:00 | 17 |
| 2022.11.14. 07:15 | 17 |
| 2022.11.14. 07:30 | 17 |
| 2022.11.14. 07:45 | 17 |
| 2022.11.14. 08:00 | 17 |
| 2022.11.14. 08:15 | 17 |
| 2022.11.14. 08:30 | 17 |
| 2022.11.14. 08:45 | 17 |
| 2022.11.14. 09:00 | 17 |
| 2022.11.14. 09:15 | 17 |
| 2022.11.14. 09:30 | 17 |
| 2022.11.14. 09:45 | 17 |
| 2022.11.14. 10:00 | 17 |
| 2022.11.14. 10:15 | 17 |
| 2022.11.14. 10:30 | 17 |
| 2022.11.14. 10:45 | 17 |
| 2022.11.14. 11:00 | 17 |
| 2022.11.14. 11:15 | 17 |
| 2022.11.14. 11:30 | 17 |
| 2022.11.14. 11:45 | 17 |
| 2022.11.14. 12:00 | 17 |
| 2022.11.14. 12:15 | 17 |
| 2022.11.14. 12:30 | 17 |
| 2022.11.14. 12:45 | 17 |
| 2022.11.14. 13:00 | 17 |
| 2022.11.14. 13:15 | 17 |
| 2022.11.14. 13:30 | 17 |
| 2022.11.14. 13:45 | 17 |
| 2022.11.14. 14:00 | 17 |
| 2022.11.14. 14:15 | 17 |
| 2022.11.14. 14:30 | 17 |
| 2022.11.14. 14:45 | 17 |
| 2022.11.14. 15:00 | 17 |
| 2022.11.14. 15:15 | 17 |
| 2022.11.14. 15:30 | 17 |
| 2022.11.14. 15:45 | 17 |
| 2022.11.14. 16:00 | 17 |
| 2022.11.14. 16:15 | 17 |
| 2022.11.14. 16:30 | 17 |
| 2022.11.14. 16:45 | 17 |
| 2022.11.14. 17:00 | 17 |
| 2022.11.14. 17:15 | 17 |
| 2022.11.14. 17:30 | 17 |
| 2022.11.14. 17:45 | 17 |
| 2022.11.14. 18:00 | 17 |
| 2022.11.14. 18:15 | 17 |
| 2022.11.14. 18:30 | 17 |
| 2022.11.14. 18:45 | 17 |
| 2022.11.14. 19:00 | 17 |
| 2022.11.14. 19:15 | 17 |
| 2022.11.14. 19:30 | 17 |
| 2022.11.14. 19:45 | 17 |
| 2022.11.14. 20:00 | 17 |
| 2022.11.14. 20:15 | 17 |
| 2022.11.14. 20:30 | 17 |
| 2022.11.14. 20:45 | 17 |
| 2022.11.14. 21:00 | 17 |
| 2022.11.14. 21:15 | 17 |
| 2022.11.14. 21:30 | 17 |
| 2022.11.14. 21:45 | 17 |
| 2022.11.14. 22:00 | 17 |
| 2022.11.14. 22:15 | 17 |
| 2022.11.14. 22:30 | 17 |
| 2022.11.14. 22:45 | 17 |
| 2022.11.14. 23:00 | 17 |
| 2022.11.14. 23:15 | 17 |
| 2022.11.14. 23:30 | 17 |
| 2022.11.14. 23:45 | 17 |
| 2022.11.15. 00:00 | 17 |
| 2022.11.15. 00:15 | 17 |
| 2022.11.15. 00:30 | 17 |
| 2022.11.15. 00:45 | 17 |
| 2022.11.15. 01:00 | 17 |
| 2022.11.15. 01:15 | 17 |
| 2022.11.15. 01:30 | 17 |
| 2022.11.15. 01:45 | 17 |
| 2022.11.15. 02:00 | 17 |
| 2022.11.15. 02:15 | 17 |
| 2022.11.15. 02:30 | 17 |
| 2022.11.15. 02:45 | 17 |
| 2022.11.15. 03:00 | 17 |
| 2022.11.15. 03:15 | 17 |
| 2022.11.15. 03:30 | 17 |
| 2022.11.15. 03:45 | 17 |
| 2022.11.15. 04:00 | 17 |
| 2022.11.15. 04:15 | 17 |
| 2022.11.15. 04:30 | 17 |
| 2022.11.15. 04:45 | 17 |
| 2022.11.15. 05:00 | 17 |
| 2022.11.15. 05:15 | 17 |
| 2022.11.15. 05:30 | 17 |
| 2022.11.15. 05:45 | 17 |
| 2022.11.15. 06:00 | 17 |
| 2022.11.15. 06:15 | 17 |
| 2022.11.15. 06:30 | 17 |
| 2022.11.15. 06:45 | 17 |
| 2022.11.15. 07:00 | 17 |
| 2022.11.15. 07:15 | 17 |
| 2022.11.15. 07:30 | 17 |
| 2022.11.15. 07:45 | 17 |
| 2022.11.15. 08:00 | 17 |
| 2022.11.15. 08:15 | 17 |
| 2022.11.15. 08:30 | 17 |
| 2022.11.15. 08:45 | 17 |
| 2022.11.15. 09:00 | 17 |
| 2022.11.15. 09:15 | 17 |
| 2022.11.15. 09:30 | 17 |
| 2022.11.15. 09:45 | 17 |
| 2022.11.15. 10:00 | 17 |
| 2022.11.15. 10:15 | 17 |
| 2022.11.15. 10:30 | 17 |
| 2022.11.15. 10:45 | 17 |
| 2022.11.15. 11:00 | 17 |
| 2022.11.15. 11:15 | 17 |
| 2022.11.15. 11:30 | 17 |
| 2022.11.15. 11:45 | 17 |
| 2022.11.15. 12:00 | 17 |
| 2022.11.15. 12:15 | 17 |
| 2022.11.15. 12:30 | 17 |
| 2022.11.15. 12:45 | 17 |
| 2022.11.15. 13:00 | 17 |
| 2022.11.15. 13:15 | 17 |
| 2022.11.15. 13:30 | 17 |
| 2022.11.15. 13:45 | 17 |
| 2022.11.15. 14:00 | 17 |
| 2022.11.15. 14:15 | 17 |
| 2022.11.15. 14:30 | 17 |
| 2022.11.15. 14:45 | 17 |
| 2022.11.15. 15:00 | 17 |
| 2022.11.15. 15:15 | 17 |
| 2022.11.15. 15:30 | 17 |
| 2022.11.15. 15:45 | 17 |
| 2022.11.15. 16:00 | 17 |
| 2022.11.15. 16:15 | 17 |
| 2022.11.15. 16:30 | 17 |
| 2022.11.15. 16:45 | 17 |
| 2022.11.15. 17:00 | 17 |
| 2022.11.15. 17:15 | 17 |
| 2022.11.15. 17:30 | 17 |
| 2022.11.15. 17:45 | 17 |
| 2022.11.15. 18:00 | 17 |
| 2022.11.15. 18:15 | 17 |
| 2022.11.15. 18:30 | 17 |
| 2022.11.15. 18:45 | 17 |
| 2022.11.15. 19:00 | 17 |
| 2022.11.15. 19:15 | 17 |
| 2022.11.15. 19:30 | 17 |
| 2022.11.15. 19:45 | 17 |
| 2022.11.15. 20:00 | 17 |
| 2022.11.15. 20:15 | 17 |
| 2022.11.15. 20:30 | 17 |
| 2022.11.15. 20:45 | 17 |
| 2022.11.15. 21:00 | 17 |
| 2022.11.15. 21:15 | 17 |
| 2022.11.15. 21:30 | 17 |
| 2022.11.15. 21:45 | 17 |
| 2022.11.15. 22:00 | 17 |
| 2022.11.15. 22:15 | 17 |
| 2022.11.15. 22:30 | 17 |
| 2022.11.15. 22:45 | 17 |
| 2022.11.15. 23:00 | 17 |
| 2022.11.15. 23:15 | 17 |
| 2022.11.15. 23:30 | 17 |
| 2022.11.15. 23:45 | 17 |
| 2022.11.16. 00:00 | 14 |
| 2022.11.16. 00:15 | 14 |
| 2022.11.16. 00:30 | 14 |
| 2022.11.16. 00:45 | 14 |
| 2022.11.16. 01:00 | 14 |
| 2022.11.16. 01:15 | 14 |
| 2022.11.16. 01:30 | 14 |
| 2022.11.16. 01:45 | 14 |
| 2022.11.16. 02:00 | 14 |
| 2022.11.16. 02:15 | 14 |
| 2022.11.16. 02:30 | 14 |
| 2022.11.16. 02:45 | 14 |
| 2022.11.16. 03:00 | 14 |
| 2022.11.16. 03:15 | 14 |
| 2022.11.16. 03:30 | 14 |
| 2022.11.16. 03:45 | 14 |
| 2022.11.16. 04:00 | 14 |
| 2022.11.16. 04:15 | 14 |
| 2022.11.16. 04:30 | 14 |
| 2022.11.16. 04:45 | 14 |
| 2022.11.16. 05:00 | 14 |
| 2022.11.16. 05:15 | 14 |
| 2022.11.16. 05:30 | 14 |
| 2022.11.16. 05:45 | 14 |
| 2022.11.16. 06:00 | 14 |
| 2022.11.16. 06:15 | 14 |
| 2022.11.16. 06:30 | 14 |
| 2022.11.16. 06:45 | 14 |
| 2022.11.16. 07:00 | 14 |
| 2022.11.16. 07:15 | 14 |
| 2022.11.16. 07:30 | 14 |
| 2022.11.16. 07:45 | 14 |
| 2022.11.16. 08:00 | 14 |
| 2022.11.16. 08:15 | 14 |
| 2022.11.16. 08:30 | 14 |
| 2022.11.16. 08:45 | 14 |
| 2022.11.16. 09:00 | 14 |
| 2022.11.16. 09:15 | 14 |
| 2022.11.16. 09:30 | 14 |
| 2022.11.16. 09:45 | 14 |
| 2022.11.16. 10:00 | 14 |
| 2022.11.16. 10:15 | 14 |
| 2022.11.16. 10:30 | 14 |
| 2022.11.16. 10:45 | 14 |
| 2022.11.16. 11:00 | 14 |
| 2022.11.16. 11:15 | 14 |
| 2022.11.16. 11:30 | 14 |
| 2022.11.16. 11:45 | 14 |
| 2022.11.16. 12:00 | 14 |
| 2022.11.16. 12:15 | 14 |
| 2022.11.16. 12:30 | 14 |
| 2022.11.16. 12:45 | 14 |
| 2022.11.16. 13:00 | 14 |
| 2022.11.16. 13:15 | 14 |
| 2022.11.16. 13:30 | 14 |
| 2022.11.16. 13:45 | 14 |
| 2022.11.16. 14:00 | 14 |
| 2022.11.16. 14:15 | 14 |
| 2022.11.16. 14:30 | 14 |
| 2022.11.16. 14:45 | 14 |
| 2022.11.16. 15:00 | 14 |
| 2022.11.16. 15:15 | 14 |
| 2022.11.16. 15:30 | 14 |
| 2022.11.16. 15:45 | 14 |
| 2022.11.16. 16:00 | 14 |
| 2022.11.16. 16:15 | 14 |
| 2022.11.16. 16:30 | 14 |
| 2022.11.16. 16:45 | 14 |
| 2022.11.16. 17:00 | 14 |
| 2022.11.16. 17:15 | 14 |
| 2022.11.16. 17:30 | 14 |
| 2022.11.16. 17:45 | 14 |
| 2022.11.16. 18:00 | 14 |
| 2022.11.16. 18:15 | 14 |
| 2022.11.16. 18:30 | 14 |
| 2022.11.16. 18:45 | 14 |
| 2022.11.16. 19:00 | 14 |
| 2022.11.16. 19:15 | 14 |
| 2022.11.16. 19:30 | 14 |
| 2022.11.16. 19:45 | 14 |
| 2022.11.16. 20:00 | 14 |
| 2022.11.16. 20:15 | 14 |
| 2022.11.16. 20:30 | 14 |
| 2022.11.16. 20:45 | 14 |
| 2022.11.16. 21:00 | 14 |
| 2022.11.16. 21:15 | 14 |
| 2022.11.16. 21:30 | 14 |
| 2022.11.16. 21:45 | 14 |
| 2022.11.16. 22:00 | 14 |
| 2022.11.16. 22:15 | 14 |
| 2022.11.16. 22:30 | 14 |
| 2022.11.16. 22:45 | 14 |
| 2022.11.16. 23:00 | 14 |
| 2022.11.16. 23:15 | 14 |
| 2022.11.16. 23:30 | 14 |
| 2022.11.16. 23:45 | 14 |
| 2022.11.17. 00:00 | 14 |
| 2022.11.17. 00:15 | 14 |
| 2022.11.17. 00:30 | 14 |
| 2022.11.17. 00:45 | 14 |
| 2022.11.17. 01:00 | 14 |
| 2022.11.17. 01:15 | 14 |
| 2022.11.17. 01:30 | 14 |
| 2022.11.17. 01:45 | 14 |
| 2022.11.17. 02:00 | 14 |
| 2022.11.17. 02:15 | 14 |
| 2022.11.17. 02:30 | 14 |
| 2022.11.17. 02:45 | 14 |
| 2022.11.17. 03:00 | 14 |
| 2022.11.17. 03:15 | 14 |
| 2022.11.17. 03:30 | 14 |
| 2022.11.17. 03:45 | 14 |
| 2022.11.17. 04:00 | 14 |
| 2022.11.17. 04:15 | 14 |
| 2022.11.17. 04:30 | 14 |
| 2022.11.17. 04:45 | 14 |
| 2022.11.17. 05:00 | 14 |
| 2022.11.17. 05:15 | 14 |
| 2022.11.17. 05:30 | 14 |
| 2022.11.17. 05:45 | 14 |
| 2022.11.17. 06:00 | 14 |
| 2022.11.17. 06:15 | 14 |
| 2022.11.17. 06:30 | 14 |
| 2022.11.17. 06:45 | 14 |
| 2022.11.17. 07:00 | 14 |
| 2022.11.17. 07:15 | 14 |
| 2022.11.17. 07:30 | 14 |
| 2022.11.17. 07:45 | 14 |
| 2022.11.17. 08:00 | 14 |
| 2022.11.17. 08:15 | 14 |
| 2022.11.17. 08:30 | 14 |
| 2022.11.17. 08:45 | 14 |
| 2022.11.17. 09:00 | 14 |
| 2022.11.17. 09:15 | 14 |
| 2022.11.17. 09:30 | 14 |
| 2022.11.17. 09:45 | 14 |
| 2022.11.17. 10:00 | 14 |
| 2022.11.17. 10:15 | 14 |
| 2022.11.17. 10:30 | 14 |
| 2022.11.17. 10:45 | 14 |
| 2022.11.17. 11:00 | 14 |
| 2022.11.17. 11:15 | 14 |
| 2022.11.17. 11:30 | 14 |
| 2022.11.17. 11:45 | 14 |
| 2022.11.17. 12:00 | 14 |
| 2022.11.17. 12:15 | 14 |
| 2022.11.17. 12:30 | 14 |
| 2022.11.17. 12:45 | 14 |
| 2022.11.17. 13:00 | 14 |
| 2022.11.17. 13:15 | 14 |
| 2022.11.17. 13:30 | 14 |
| 2022.11.17. 13:45 | 14 |
| 2022.11.17. 14:00 | 14 |
| 2022.11.17. 14:15 | 14 |
| 2022.11.17. 14:30 | 14 |
| 2022.11.17. 14:45 | 14 |
| 2022.11.17. 15:00 | 14 |
| 2022.11.17. 15:15 | 14 |
| 2022.11.17. 15:30 | 14 |
| 2022.11.17. 15:45 | 14 |
| 2022.11.17. 16:00 | 14 |
| 2022.11.17. 16:15 | 14 |
| 2022.11.17. 16:30 | 14 |
| 2022.11.17. 16:45 | 14 |
| 2022.11.17. 17:00 | 14 |
| 2022.11.17. 17:15 | 14 |
| 2022.11.17. 17:30 | 14 |
| 2022.11.17. 17:45 | 14 |
| 2022.11.17. 18:00 | 14 |
| 2022.11.17. 18:15 | 14 |
| 2022.11.17. 18:30 | 14 |
| 2022.11.17. 18:45 | 14 |
| 2022.11.17. 19:00 | 14 |
| 2022.11.17. 19:15 | 14 |
| 2022.11.17. 19:30 | 14 |
| 2022.11.17. 19:45 | 14 |
| 2022.11.17. 20:00 | 14 |
| 2022.11.17. 20:15 | 14 |
| 2022.11.17. 20:30 | 14 |
| 2022.11.17. 20:45 | 14 |
| 2022.11.17. 21:00 | 14 |
| 2022.11.17. 21:15 | 14 |
| 2022.11.17. 21:30 | 14 |
| 2022.11.17. 21:45 | 14 |
| 2022.11.17. 22:00 | 14 |
| 2022.11.17. 22:15 | 14 |
| 2022.11.17. 22:30 | 14 |
| 2022.11.17. 22:45 | 14 |
| 2022.11.17. 23:00 | 14 |
| 2022.11.17. 23:15 | 14 |
| 2022.11.17. 23:30 | 14 |
| 2022.11.17. 23:45 | 14 |
| 2022.11.18. 00:00 | 14 |
| 2022.11.18. 00:15 | 14 |
| 2022.11.18. 00:30 | 14 |
| 2022.11.18. 00:45 | 14 |
| 2022.11.18. 01:00 | 14 |
| 2022.11.18. 01:15 | 14 |
| 2022.11.18. 01:30 | 14 |
| 2022.11.18. 01:45 | 14 |
| 2022.11.18. 02:00 | 14 |
| 2022.11.18. 02:15 | 14 |
| 2022.11.18. 02:30 | 14 |
| 2022.11.18. 02:45 | 14 |
| 2022.11.18. 03:00 | 14 |
| 2022.11.18. 03:15 | 14 |
| 2022.11.18. 03:30 | 14 |
| 2022.11.18. 03:45 | 14 |
| 2022.11.18. 04:00 | 14 |
| 2022.11.18. 04:15 | 14 |
| 2022.11.18. 04:30 | 14 |
| 2022.11.18. 04:45 | 14 |
| 2022.11.18. 05:00 | 14 |
| 2022.11.18. 05:15 | 14 |
| 2022.11.18. 05:30 | 14 |
| 2022.11.18. 05:45 | 14 |
| 2022.11.18. 06:00 | 14 |
| 2022.11.18. 06:15 | 14 |
| 2022.11.18. 06:30 | 14 |
| 2022.11.18. 06:45 | 14 |
| 2022.11.18. 07:00 | 14 |
| 2022.11.18. 07:15 | 14 |
| 2022.11.18. 07:30 | 14 |
| 2022.11.18. 07:45 | 14 |
| 2022.11.18. 08:00 | 14 |
| 2022.11.18. 08:15 | 14 |
| 2022.11.18. 08:30 | 14 |
| 2022.11.18. 08:45 | 14 |
| 2022.11.18. 09:00 | 14 |
| 2022.11.18. 09:15 | 14 |
| 2022.11.18. 09:30 | 14 |
| 2022.11.18. 09:45 | 14 |
| 2022.11.18. 10:00 | 14 |
| 2022.11.18. 10:15 | 14 |
| 2022.11.18. 10:30 | 14 |
| 2022.11.18. 10:45 | 14 |
| 2022.11.18. 11:00 | 14 |
| 2022.11.18. 11:15 | 14 |
| 2022.11.18. 11:30 | 14 |
| 2022.11.18. 11:45 | 14 |
| 2022.11.18. 12:00 | 14 |
| 2022.11.18. 12:15 | 14 |
| 2022.11.18. 12:30 | 14 |
| 2022.11.18. 12:45 | 14 |
| 2022.11.18. 13:00 | 14 |
| 2022.11.18. 13:15 | 14 |
| 2022.11.18. 13:30 | 14 |
| 2022.11.18. 13:45 | 14 |
| 2022.11.18. 14:00 | 14 |
| 2022.11.18. 14:15 | 14 |
| 2022.11.18. 14:30 | 14 |
| 2022.11.18. 14:45 | 14 |
| 2022.11.18. 15:00 | 14 |
| 2022.11.18. 15:15 | 14 |
| 2022.11.18. 15:30 | 14 |
| 2022.11.18. 15:45 | 14 |
| 2022.11.18. 16:00 | 14 |
| 2022.11.18. 16:15 | 14 |
| 2022.11.18. 16:30 | 14 |
| 2022.11.18. 16:45 | 14 |
| 2022.11.18. 17:00 | 14 |
| 2022.11.18. 17:15 | 14 |
| 2022.11.18. 17:30 | 14 |
| 2022.11.18. 17:45 | 14 |
| 2022.11.18. 18:00 | 14 |
| 2022.11.18. 18:15 | 14 |
| 2022.11.18. 18:30 | 14 |
| 2022.11.18. 18:45 | 14 |
| 2022.11.18. 19:00 | 14 |
| 2022.11.18. 19:15 | 14 |
| 2022.11.18. 19:30 | 14 |
| 2022.11.18. 19:45 | 14 |
| 2022.11.18. 20:00 | 14 |
| 2022.11.18. 20:15 | 14 |
| 2022.11.18. 20:30 | 14 |
| 2022.11.18. 20:45 | 14 |
| 2022.11.18. 21:00 | 14 |
| 2022.11.18. 21:15 | 14 |
| 2022.11.18. 21:30 | 14 |
| 2022.11.18. 21:45 | 14 |
| 2022.11.18. 22:00 | 14 |
| 2022.11.18. 22:15 | 14 |
| 2022.11.18. 22:30 | 14 |
| 2022.11.18. 22:45 | 14 |
| 2022.11.18. 23:00 | 14 |
| 2022.11.18. 23:15 | 14 |
| 2022.11.18. 23:30 | 14 |
| 2022.11.18. 23:45 | 14 |
| 2022.11.19. 00:00 | 14 |
| 2022.11.19. 00:15 | 14 |
| 2022.11.19. 00:30 | 14 |
| 2022.11.19. 00:45 | 14 |
| 2022.11.19. 01:00 | 14 |
| 2022.11.19. 01:15 | 14 |
| 2022.11.19. 01:30 | 14 |
| 2022.11.19. 01:45 | 14 |
| 2022.11.19. 02:00 | 14 |
| 2022.11.19. 02:15 | 14 |
| 2022.11.19. 02:30 | 14 |
| 2022.11.19. 02:45 | 14 |
| 2022.11.19. 03:00 | 14 |
| 2022.11.19. 03:15 | 14 |
| 2022.11.19. 03:30 | 14 |
| 2022.11.19. 03:45 | 14 |
| 2022.11.19. 04:00 | 14 |
| 2022.11.19. 04:15 | 14 |
| 2022.11.19. 04:30 | 14 |
| 2022.11.19. 04:45 | 14 |
| 2022.11.19. 05:00 | 14 |
| 2022.11.19. 05:15 | 14 |
| 2022.11.19. 05:30 | 14 |
| 2022.11.19. 05:45 | 14 |
| 2022.11.19. 06:00 | 14 |
| 2022.11.19. 06:15 | 14 |
| 2022.11.19. 06:30 | 14 |
| 2022.11.19. 06:45 | 14 |
| 2022.11.19. 07:00 | 14 |
| 2022.11.19. 07:15 | 14 |
| 2022.11.19. 07:30 | 14 |
| 2022.11.19. 07:45 | 14 |
| 2022.11.19. 08:00 | 14 |
| 2022.11.19. 08:15 | 14 |
| 2022.11.19. 08:30 | 14 |
| 2022.11.19. 08:45 | 14 |
| 2022.11.19. 09:00 | 14 |
| 2022.11.19. 09:15 | 14 |
| 2022.11.19. 09:30 | 14 |
| 2022.11.19. 09:45 | 14 |
| 2022.11.19. 10:00 | 14 |
| 2022.11.19. 10:15 | 14 |
| 2022.11.19. 10:30 | 14 |
| 2022.11.19. 10:45 | 14 |
| 2022.11.19. 11:00 | 14 |
| 2022.11.19. 11:15 | 14 |
| 2022.11.19. 11:30 | 14 |
| 2022.11.19. 11:45 | 14 |
| 2022.11.19. 12:00 | 14 |
| 2022.11.19. 12:15 | 14 |
| 2022.11.19. 12:30 | 14 |
| 2022.11.19. 12:45 | 14 |
| 2022.11.19. 13:00 | 14 |
| 2022.11.19. 13:15 | 14 |
| 2022.11.19. 13:30 | 14 |
| 2022.11.19. 13:45 | 14 |
| 2022.11.19. 14:00 | 14 |
| 2022.11.19. 14:15 | 14 |
| 2022.11.19. 14:30 | 14 |
| 2022.11.19. 14:45 | 14 |
| 2022.11.19. 15:00 | 14 |
| 2022.11.19. 15:15 | 14 |
| 2022.11.19. 15:30 | 14 |
| 2022.11.19. 15:45 | 14 |
| 2022.11.19. 16:00 | 14 |
| 2022.11.19. 16:15 | 14 |
| 2022.11.19. 16:30 | 14 |
| 2022.11.19. 16:45 | 14 |
| 2022.11.19. 17:00 | 14 |
| 2022.11.19. 17:15 | 14 |
| 2022.11.19. 17:30 | 14 |
| 2022.11.19. 17:45 | 14 |
| 2022.11.19. 18:00 | 14 |
| 2022.11.19. 18:15 | 14 |
| 2022.11.19. 18:30 | 14 |
| 2022.11.19. 18:45 | 14 |
| 2022.11.19. 19:00 | 14 |
| 2022.11.19. 19:15 | 14 |
| 2022.11.19. 19:30 | 14 |
| 2022.11.19. 19:45 | 14 |
| 2022.11.19. 20:00 | 14 |
| 2022.11.19. 20:15 | 14 |
| 2022.11.19. 20:30 | 14 |
| 2022.11.19. 20:45 | 14 |
| 2022.11.19. 21:00 | 14 |
| 2022.11.19. 21:15 | 14 |
| 2022.11.19. 21:30 | 14 |
| 2022.11.19. 21:45 | 14 |
| 2022.11.19. 22:00 | 14 |
| 2022.11.19. 22:15 | 14 |
| 2022.11.19. 22:30 | 14 |
| 2022.11.19. 22:45 | 14 |
| 2022.11.19. 23:00 | 14 |
| 2022.11.19. 23:15 | 14 |
| 2022.11.19. 23:30 | 14 |
| 2022.11.19. 23:45 | 14 |
| 2022.11.20. 00:00 | 14 |
| 2022.11.20. 00:15 | 14 |
| 2022.11.20. 00:30 | 14 |
| 2022.11.20. 00:45 | 14 |
| 2022.11.20. 01:00 | 14 |
| 2022.11.20. 01:15 | 14 |
| 2022.11.20. 01:30 | 14 |
| 2022.11.20. 01:45 | 14 |
| 2022.11.20. 02:00 | 14 |
| 2022.11.20. 02:15 | 14 |
| 2022.11.20. 02:30 | 14 |
| 2022.11.20. 02:45 | 14 |
| 2022.11.20. 03:00 | 14 |
| 2022.11.20. 03:15 | 14 |
| 2022.11.20. 03:30 | 14 |
| 2022.11.20. 03:45 | 14 |
| 2022.11.20. 04:00 | 14 |
| 2022.11.20. 04:15 | 14 |
| 2022.11.20. 04:30 | 14 |
| 2022.11.20. 04:45 | 14 |
| 2022.11.20. 05:00 | 14 |
| 2022.11.20. 05:15 | 14 |
| 2022.11.20. 05:30 | 14 |
| 2022.11.20. 05:45 | 14 |
| 2022.11.20. 06:00 | 14 |
| 2022.11.20. 06:15 | 14 |
| 2022.11.20. 06:30 | 14 |
| 2022.11.20. 06:45 | 14 |
| 2022.11.20. 07:00 | 14 |
| 2022.11.20. 07:15 | 14 |
| 2022.11.20. 07:30 | 14 |
| 2022.11.20. 07:45 | 14 |
| 2022.11.20. 08:00 | 14 |
| 2022.11.20. 08:15 | 14 |
| 2022.11.20. 08:30 | 14 |
| 2022.11.20. 08:45 | 14 |
| 2022.11.20. 09:00 | 14 |
| 2022.11.20. 09:15 | 14 |
| 2022.11.20. 09:30 | 14 |
| 2022.11.20. 09:45 | 14 |
| 2022.11.20. 10:00 | 14 |
| 2022.11.20. 10:15 | 14 |
| 2022.11.20. 10:30 | 14 |
| 2022.11.20. 10:45 | 14 |
| 2022.11.20. 11:00 | 14 |
| 2022.11.20. 11:15 | 14 |
| 2022.11.20. 11:30 | 14 |
| 2022.11.20. 11:45 | 14 |
| 2022.11.20. 12:00 | 14 |
| 2022.11.20. 12:15 | 14 |
| 2022.11.20. 12:30 | 14 |
| 2022.11.20. 12:45 | 14 |
| 2022.11.20. 13:00 | 14 |
| 2022.11.20. 13:15 | 14 |
| 2022.11.20. 13:30 | 14 |
| 2022.11.20. 13:45 | 14 |
| 2022.11.20. 14:00 | 14 |
| 2022.11.20. 14:15 | 14 |
| 2022.11.20. 14:30 | 14 |
| 2022.11.20. 14:45 | 14 |
| 2022.11.20. 15:00 | 14 |
| 2022.11.20. 15:15 | 14 |
| 2022.11.20. 15:30 | 14 |
| 2022.11.20. 15:45 | 14 |
| 2022.11.20. 16:00 | 14 |
| 2022.11.20. 16:15 | 14 |
| 2022.11.20. 16:30 | 14 |
| 2022.11.20. 16:45 | 14 |
| 2022.11.20. 17:00 | 14 |
| 2022.11.20. 17:15 | 14 |
| 2022.11.20. 17:30 | 14 |
| 2022.11.20. 17:45 | 14 |
| 2022.11.20. 18:00 | 14 |
| 2022.11.20. 18:15 | 14 |
| 2022.11.20. 18:30 | 14 |
| 2022.11.20. 18:45 | 14 |
| 2022.11.20. 19:00 | 14 |
| 2022.11.20. 19:15 | 14 |
| 2022.11.20. 19:30 | 14 |
| 2022.11.20. 19:45 | 14 |
| 2022.11.20. 20:00 | 14 |
| 2022.11.20. 20:15 | 14 |
| 2022.11.20. 20:30 | 14 |
| 2022.11.20. 20:45 | 14 |
| 2022.11.20. 21:00 | 14 |
| 2022.11.20. 21:15 | 14 |
| 2022.11.20. 21:30 | 14 |
| 2022.11.20. 21:45 | 14 |
| 2022.11.20. 22:00 | 14 |
| 2022.11.20. 22:15 | 14 |
| 2022.11.20. 22:30 | 14 |
| 2022.11.20. 22:45 | 14 |
| 2022.11.20. 23:00 | 14 |
| 2022.11.20. 23:15 | 14 |
| 2022.11.20. 23:30 | 14 |
| 2022.11.20. 23:45 | 14 |
| 2022.11.21. 00:00 | 14 |
| 2022.11.21. 00:15 | 14 |
| 2022.11.21. 00:30 | 14 |
| 2022.11.21. 00:45 | 14 |
| 2022.11.21. 01:00 | 14 |
| 2022.11.21. 01:15 | 14 |
| 2022.11.21. 01:30 | 14 |
| 2022.11.21. 01:45 | 14 |
| 2022.11.21. 02:00 | 14 |
| 2022.11.21. 02:15 | 14 |
| 2022.11.21. 02:30 | 14 |
| 2022.11.21. 02:45 | 14 |
| 2022.11.21. 03:00 | 14 |
| 2022.11.21. 03:15 | 14 |
| 2022.11.21. 03:30 | 14 |
| 2022.11.21. 03:45 | 14 |
| 2022.11.21. 04:00 | 14 |
| 2022.11.21. 04:15 | 14 |
| 2022.11.21. 04:30 | 14 |
| 2022.11.21. 04:45 | 14 |
| 2022.11.21. 05:00 | 14 |
| 2022.11.21. 05:15 | 14 |
| 2022.11.21. 05:30 | 14 |
| 2022.11.21. 05:45 | 14 |
| 2022.11.21. 06:00 | 14 |
| 2022.11.21. 06:15 | 14 |
| 2022.11.21. 06:30 | 14 |
| 2022.11.21. 06:45 | 14 |
| 2022.11.21. 07:00 | 14 |
| 2022.11.21. 07:15 | 14 |
| 2022.11.21. 07:30 | 14 |
| 2022.11.21. 07:45 | 14 |
| 2022.11.21. 08:00 | 14 |
| 2022.11.21. 08:15 | 14 |
| 2022.11.21. 08:30 | 14 |
| 2022.11.21. 08:45 | 14 |
| 2022.11.21. 09:00 | 14 |
| 2022.11.21. 09:15 | 14 |
| 2022.11.21. 09:30 | 14 |
| 2022.11.21. 09:45 | 14 |
| 2022.11.21. 10:00 | 14 |
| 2022.11.21. 10:15 | 14 |
| 2022.11.21. 10:30 | 14 |
| 2022.11.21. 10:45 | 14 |
| 2022.11.21. 11:00 | 14 |
| 2022.11.21. 11:15 | 14 |
| 2022.11.21. 11:30 | 14 |
| 2022.11.21. 11:45 | 14 |
| 2022.11.21. 12:00 | 14 |
| 2022.11.21. 12:15 | 14 |
| 2022.11.21. 12:30 | 14 |
| 2022.11.21. 12:45 | 14 |
| 2022.11.21. 13:00 | 14 |
| 2022.11.21. 13:15 | 14 |
| 2022.11.21. 13:30 | 14 |
| 2022.11.21. 13:45 | 14 |
| 2022.11.21. 14:00 | 14 |
| 2022.11.21. 14:15 | 14 |
| 2022.11.21. 14:30 | 14 |
| 2022.11.21. 14:45 | 14 |
| 2022.11.21. 15:00 | 14 |
| 2022.11.21. 15:15 | 14 |
| 2022.11.21. 15:30 | 14 |
| 2022.11.21. 15:45 | 14 |
| 2022.11.21. 16:00 | 14 |
| 2022.11.21. 16:15 | 14 |
| 2022.11.21. 16:30 | 14 |
| 2022.11.21. 16:45 | 14 |
| 2022.11.21. 17:00 | 14 |
| 2022.11.21. 17:15 | 14 |
| 2022.11.21. 17:30 | 14 |
| 2022.11.21. 17:45 | 14 |
| 2022.11.21. 18:00 | 14 |
| 2022.11.21. 18:15 | 14 |
| 2022.11.21. 18:30 | 14 |
| 2022.11.21. 18:45 | 14 |
| 2022.11.21. 19:00 | 14 |
| 2022.11.21. 19:15 | 14 |
| 2022.11.21. 19:30 | 14 |
| 2022.11.21. 19:45 | 14 |
| 2022.11.21. 20:00 | 14 |
| 2022.11.21. 20:15 | 14 |
| 2022.11.21. 20:30 | 14 |
| 2022.11.21. 20:45 | 14 |
| 2022.11.21. 21:00 | 14 |
| 2022.11.21. 21:15 | 14 |
| 2022.11.21. 21:30 | 14 |
| 2022.11.21. 21:45 | 14 |
| 2022.11.21. 22:00 | 14 |
| 2022.11.21. 22:15 | 14 |
| 2022.11.21. 22:30 | 14 |
| 2022.11.21. 22:45 | 14 |
| 2022.11.21. 23:00 | 14 |
| 2022.11.21. 23:15 | 14 |
| 2022.11.21. 23:30 | 14 |
| 2022.11.21. 23:45 | 14 |
| 2022.11.22. 00:00 | 14 |
| 2022.11.22. 00:15 | 14 |
| 2022.11.22. 00:30 | 14 |
| 2022.11.22. 00:45 | 14 |
| 2022.11.22. 01:00 | 14 |
| 2022.11.22. 01:15 | 14 |
| 2022.11.22. 01:30 | 14 |
| 2022.11.22. 01:45 | 14 |
| 2022.11.22. 02:00 | 14 |
| 2022.11.22. 02:15 | 14 |
| 2022.11.22. 02:30 | 14 |
| 2022.11.22. 02:45 | 14 |
| 2022.11.22. 03:00 | 14 |
| 2022.11.22. 03:15 | 14 |
| 2022.11.22. 03:30 | 14 |
| 2022.11.22. 03:45 | 14 |
| 2022.11.22. 04:00 | 14 |
| 2022.11.22. 04:15 | 14 |
| 2022.11.22. 04:30 | 14 |
| 2022.11.22. 04:45 | 14 |
| 2022.11.22. 05:00 | 14 |
| 2022.11.22. 05:15 | 14 |
| 2022.11.22. 05:30 | 14 |
| 2022.11.22. 05:45 | 14 |
| 2022.11.22. 06:00 | 14 |
| 2022.11.22. 06:15 | 14 |
| 2022.11.22. 06:30 | 14 |
| 2022.11.22. 06:45 | 14 |
| 2022.11.22. 07:00 | 14 |
| 2022.11.22. 07:15 | 14 |
| 2022.11.22. 07:30 | 14 |
| 2022.11.22. 07:45 | 14 |
| 2022.11.22. 08:00 | 14 |
| 2022.11.22. 08:15 | 14 |
| 2022.11.22. 08:30 | 14 |
| 2022.11.22. 08:45 | 14 |
| 2022.11.22. 09:00 | 14 |
| 2022.11.22. 09:15 | 14 |
| 2022.11.22. 09:30 | 14 |
| 2022.11.22. 09:45 | 14 |
| 2022.11.22. 10:00 | 14 |
| 2022.11.22. 10:15 | 14 |
| 2022.11.22. 10:30 | 14 |
| 2022.11.22. 10:45 | 14 |
| 2022.11.22. 11:00 | 14 |
| 2022.11.22. 11:15 | 14 |
| 2022.11.22. 11:30 | 14 |
| 2022.11.22. 11:45 | 14 |
| 2022.11.22. 12:00 | 14 |
| 2022.11.22. 12:15 | 14 |
| 2022.11.22. 12:30 | 14 |
| 2022.11.22. 12:45 | 14 |
| 2022.11.22. 13:00 | 14 |
| 2022.11.22. 13:15 | 14 |
| 2022.11.22. 13:30 | 14 |
| 2022.11.22. 13:45 | 14 |
| 2022.11.22. 14:00 | 14 |
| 2022.11.22. 14:15 | 14 |
| 2022.11.22. 14:30 | 14 |
| 2022.11.22. 14:45 | 14 |
| 2022.11.22. 15:00 | 14 |
| 2022.11.22. 15:15 | 14 |
| 2022.11.22. 15:30 | 14 |
| 2022.11.22. 15:45 | 14 |
| 2022.11.22. 16:00 | 14 |
| 2022.11.22. 16:15 | 14 |
| 2022.11.22. 16:30 | 14 |
| 2022.11.22. 16:45 | 14 |
| 2022.11.22. 17:00 | 14 |
| 2022.11.22. 17:15 | 14 |
| 2022.11.22. 17:30 | 14 |
| 2022.11.22. 17:45 | 14 |
| 2022.11.22. 18:00 | 14 |
| 2022.11.22. 18:15 | 14 |
| 2022.11.22. 18:30 | 14 |
| 2022.11.22. 18:45 | 14 |
| 2022.11.22. 19:00 | 14 |
| 2022.11.22. 19:15 | 14 |
| 2022.11.22. 19:30 | 14 |
| 2022.11.22. 19:45 | 14 |
| 2022.11.22. 20:00 | 14 |
| 2022.11.22. 20:15 | 14 |
| 2022.11.22. 20:30 | 14 |
| 2022.11.22. 20:45 | 14 |
| 2022.11.22. 21:00 | 14 |
| 2022.11.22. 21:15 | 14 |
| 2022.11.22. 21:30 | 14 |
| 2022.11.22. 21:45 | 14 |
| 2022.11.22. 22:00 | 14 |
| 2022.11.22. 22:15 | 14 |
| 2022.11.22. 22:30 | 14 |
| 2022.11.22. 22:45 | 14 |
| 2022.11.22. 23:00 | 14 |
| 2022.11.22. 23:15 | 14 |
| 2022.11.22. 23:30 | 14 |
| 2022.11.22. 23:45 | 14 |
| 2022.11.23. 00:00 | 14 |
| 2022.11.23. 00:15 | 14 |
| 2022.11.23. 00:30 | 14 |
| 2022.11.23. 00:45 | 14 |
| 2022.11.23. 01:00 | 14 |
| 2022.11.23. 01:15 | 14 |
| 2022.11.23. 01:30 | 14 |
| 2022.11.23. 01:45 | 14 |
| 2022.11.23. 02:00 | 14 |
| 2022.11.23. 02:15 | 14 |
| 2022.11.23. 02:30 | 14 |
| 2022.11.23. 02:45 | 14 |
| 2022.11.23. 03:00 | 14 |
| 2022.11.23. 03:15 | 14 |
| 2022.11.23. 03:30 | 14 |
| 2022.11.23. 03:45 | 14 |
| 2022.11.23. 04:00 | 14 |
| 2022.11.23. 04:15 | 14 |
| 2022.11.23. 04:30 | 14 |
| 2022.11.23. 04:45 | 14 |
| 2022.11.23. 05:00 | 14 |
| 2022.11.23. 05:15 | 14 |
| 2022.11.23. 05:30 | 14 |
| 2022.11.23. 05:45 | 14 |
| 2022.11.23. 06:00 | 14 |
| 2022.11.23. 06:15 | 14 |
| 2022.11.23. 06:30 | 14 |
| 2022.11.23. 06:45 | 14 |
| 2022.11.23. 07:00 | 14 |
| 2022.11.23. 07:15 | 14 |
| 2022.11.23. 07:30 | 14 |
| 2022.11.23. 07:45 | 14 |
| 2022.11.23. 08:00 | 14 |
| 2022.11.23. 08:15 | 14 |
| 2022.11.23. 08:30 | 14 |
| 2022.11.23. 08:45 | 14 |
| 2022.11.23. 09:00 | 14 |
| 2022.11.23. 09:15 | 14 |
| 2022.11.23. 09:30 | 14 |
| 2022.11.23. 09:45 | 14 |
| 2022.11.23. 10:00 | 14 |
| 2022.11.23. 10:15 | 14 |
| 2022.11.23. 10:30 | 14 |
| 2022.11.23. 10:45 | 14 |
| 2022.11.23. 11:00 | 14 |
| 2022.11.23. 11:15 | 14 |
| 2022.11.23. 11:30 | 14 |
| 2022.11.23. 11:45 | 14 |
| 2022.11.23. 12:00 | 14 |
| 2022.11.23. 12:15 | 14 |
| 2022.11.23. 12:30 | 14 |
| 2022.11.23. 12:45 | 14 |
| 2022.11.23. 13:00 | 14 |
| 2022.11.23. 13:15 | 14 |
| 2022.11.23. 13:30 | 14 |
| 2022.11.23. 13:45 | 14 |
| 2022.11.23. 14:00 | 14 |
| 2022.11.23. 14:15 | 14 |
| 2022.11.23. 14:30 | 14 |
| 2022.11.23. 14:45 | 14 |
| 2022.11.23. 15:00 | 14 |
| 2022.11.23. 15:15 | 14 |
| 2022.11.23. 15:30 | 14 |
| 2022.11.23. 15:45 | 14 |
| 2022.11.23. 16:00 | 14 |
| 2022.11.23. 16:15 | 14 |
| 2022.11.23. 16:30 | 14 |
| 2022.11.23. 16:45 | 14 |
| 2022.11.23. 17:00 | 14 |
| 2022.11.23. 17:15 | 14 |
| 2022.11.23. 17:30 | 14 |
| 2022.11.23. 17:45 | 14 |
| 2022.11.23. 18:00 | 14 |
| 2022.11.23. 18:15 | 14 |
| 2022.11.23. 18:30 | 14 |
| 2022.11.23. 18:45 | 14 |
| 2022.11.23. 19:00 | 14 |
| 2022.11.23. 19:15 | 14 |
| 2022.11.23. 19:30 | 14 |
| 2022.11.23. 19:45 | 14 |
| 2022.11.23. 20:00 | 14 |
| 2022.11.23. 20:15 | 14 |
| 2022.11.23. 20:30 | 14 |
| 2022.11.23. 20:45 | 14 |
| 2022.11.23. 21:00 | 14 |
| 2022.11.23. 21:15 | 14 |
| 2022.11.23. 21:30 | 14 |
| 2022.11.23. 21:45 | 14 |
| 2022.11.23. 22:00 | 14 |
| 2022.11.23. 22:15 | 14 |
| 2022.11.23. 22:30 | 14 |
| 2022.11.23. 22:45 | 14 |
| 2022.11.23. 23:00 | 14 |
| 2022.11.23. 23:15 | 14 |
| 2022.11.23. 23:30 | 14 |
| 2022.11.23. 23:45 | 14 |
| 2022.11.24. 00:00 | 14 |
| 2022.11.24. 00:15 | 14 |
| 2022.11.24. 00:30 | 14 |
| 2022.11.24. 00:45 | 14 |
| 2022.11.24. 01:00 | 14 |
| 2022.11.24. 01:15 | 14 |
| 2022.11.24. 01:30 | 14 |
| 2022.11.24. 01:45 | 14 |
| 2022.11.24. 02:00 | 14 |
| 2022.11.24. 02:15 | 14 |
| 2022.11.24. 02:30 | 14 |
| 2022.11.24. 02:45 | 14 |
| 2022.11.24. 03:00 | 14 |
| 2022.11.24. 03:15 | 14 |
| 2022.11.24. 03:30 | 14 |
| 2022.11.24. 03:45 | 14 |
| 2022.11.24. 04:00 | 14 |
| 2022.11.24. 04:15 | 14 |
| 2022.11.24. 04:30 | 14 |
| 2022.11.24. 04:45 | 14 |
| 2022.11.24. 05:00 | 14 |
| 2022.11.24. 05:15 | 14 |
| 2022.11.24. 05:30 | 14 |
| 2022.11.24. 05:45 | 14 |
| 2022.11.24. 06:00 | 14 |
| 2022.11.24. 06:15 | 14 |
| 2022.11.24. 06:30 | 14 |
| 2022.11.24. 06:45 | 14 |
| 2022.11.24. 07:00 | 14 |
| 2022.11.24. 07:15 | 14 |
| 2022.11.24. 07:30 | 14 |
| 2022.11.24. 07:45 | 14 |
| 2022.11.24. 08:00 | 14 |
| 2022.11.24. 08:15 | 14 |
| 2022.11.24. 08:30 | 14 |
| 2022.11.24. 08:45 | 14 |
| 2022.11.24. 09:00 | 14 |
| 2022.11.24. 09:15 | 14 |
| 2022.11.24. 09:30 | 14 |
| 2022.11.24. 09:45 | 14 |
| 2022.11.24. 10:00 | 14 |
| 2022.11.24. 10:15 | 14 |
| 2022.11.24. 10:30 | 14 |
| 2022.11.24. 10:45 | 14 |
| 2022.11.24. 11:00 | 14 |
| 2022.11.24. 11:15 | 14 |
| 2022.11.24. 11:30 | 14 |
| 2022.11.24. 11:45 | 14 |
| 2022.11.24. 12:00 | 14 |
| 2022.11.24. 12:15 | 14 |
| 2022.11.24. 12:30 | 14 |
| 2022.11.24. 12:45 | 14 |
| 2022.11.24. 13:00 | 14 |
| 2022.11.24. 13:15 | 14 |
| 2022.11.24. 13:30 | 14 |
| 2022.11.24. 13:45 | 14 |
| 2022.11.24. 14:00 | 14 |
| 2022.11.24. 14:15 | 14 |
| 2022.11.24. 14:30 | 14 |
| 2022.11.24. 14:45 | 14 |
| 2022.11.24. 15:00 | 14 |
| 2022.11.24. 15:15 | 14 |
| 2022.11.24. 15:30 | 14 |
| 2022.11.24. 15:45 | 14 |
| 2022.11.24. 16:00 | 14 |
| 2022.11.24. 16:15 | 14 |
| 2022.11.24. 16:30 | 14 |
| 2022.11.24. 16:45 | 14 |
| 2022.11.24. 17:00 | 14 |
| 2022.11.24. 17:15 | 14 |
| 2022.11.24. 17:30 | 14 |
| 2022.11.24. 17:45 | 14 |
| 2022.11.24. 18:00 | 14 |
| 2022.11.24. 18:15 | 14 |
| 2022.11.24. 18:30 | 14 |
| 2022.11.24. 18:45 | 14 |
| 2022.11.24. 19:00 | 14 |
| 2022.11.24. 19:15 | 14 |
| 2022.11.24. 19:30 | 14 |
| 2022.11.24. 19:45 | 14 |
| 2022.11.24. 20:00 | 14 |
| 2022.11.24. 20:15 | 14 |
| 2022.11.24. 20:30 | 14 |
| 2022.11.24. 20:45 | 14 |
| 2022.11.24. 21:00 | 14 |
| 2022.11.24. 21:15 | 14 |
| 2022.11.24. 21:30 | 14 |
| 2022.11.24. 21:45 | 14 |
| 2022.11.24. 22:00 | 14 |
| 2022.11.24. 22:15 | 14 |
| 2022.11.24. 22:30 | 14 |
| 2022.11.24. 22:45 | 14 |
| 2022.11.24. 23:00 | 14 |
| 2022.11.24. 23:15 | 14 |
| 2022.11.24. 23:30 | 14 |
| 2022.11.24. 23:45 | 14 |
| 2022.11.25. 00:00 | 14 |
| 2022.11.25. 00:15 | 14 |
| 2022.11.25. 00:30 | 14 |
| 2022.11.25. 00:45 | 14 |
| 2022.11.25. 01:00 | 14 |
| 2022.11.25. 01:15 | 14 |
| 2022.11.25. 01:30 | 14 |
| 2022.11.25. 01:45 | 14 |
| 2022.11.25. 02:00 | 14 |
| 2022.11.25. 02:15 | 14 |
| 2022.11.25. 02:30 | 14 |
| 2022.11.25. 02:45 | 14 |
| 2022.11.25. 03:00 | 14 |
| 2022.11.25. 03:15 | 14 |
| 2022.11.25. 03:30 | 14 |
| 2022.11.25. 03:45 | 14 |
| 2022.11.25. 04:00 | 14 |
| 2022.11.25. 04:15 | 14 |
| 2022.11.25. 04:30 | 14 |
| 2022.11.25. 04:45 | 14 |
| 2022.11.25. 05:00 | 14 |
| 2022.11.25. 05:15 | 14 |
| 2022.11.25. 05:30 | 14 |
| 2022.11.25. 05:45 | 14 |
| 2022.11.25. 06:00 | 14 |
| 2022.11.25. 06:15 | 14 |
| 2022.11.25. 06:30 | 14 |
| 2022.11.25. 06:45 | 14 |
| 2022.11.25. 07:00 | 14 |
| 2022.11.25. 07:15 | 14 |
| 2022.11.25. 07:30 | 14 |
| 2022.11.25. 07:45 | 14 |
| 2022.11.25. 08:00 | 14 |
| 2022.11.25. 08:15 | 14 |
| 2022.11.25. 08:30 | 14 |
| 2022.11.25. 08:45 | 14 |
| 2022.11.25. 09:00 | 14 |
| 2022.11.25. 09:15 | 14 |
| 2022.11.25. 09:30 | 14 |
| 2022.11.25. 09:45 | 14 |
| 2022.11.25. 10:00 | 14 |
| 2022.11.25. 10:15 | 14 |
| 2022.11.25. 10:30 | 14 |
| 2022.11.25. 10:45 | 14 |
| 2022.11.25. 11:00 | 14 |
| 2022.11.25. 11:15 | 14 |
| 2022.11.25. 11:30 | 14 |
| 2022.11.25. 11:45 | 14 |
| 2022.11.25. 12:00 | 14 |
| 2022.11.25. 12:15 | 14 |
| 2022.11.25. 12:30 | 14 |
| 2022.11.25. 12:45 | 14 |
| 2022.11.25. 13:00 | 14 |
| 2022.11.25. 13:15 | 14 |
| 2022.11.25. 13:30 | 14 |
| 2022.11.25. 13:45 | 14 |
| 2022.11.25. 14:00 | 14 |
| 2022.11.25. 14:15 | 14 |
| 2022.11.25. 14:30 | 14 |
| 2022.11.25. 14:45 | 14 |
| 2022.11.25. 15:00 | 14 |
| 2022.11.25. 15:15 | 14 |
| 2022.11.25. 15:30 | 14 |
| 2022.11.25. 15:45 | 14 |
| 2022.11.25. 16:00 | 14 |
| 2022.11.25. 16:15 | 14 |
| 2022.11.25. 16:30 | 14 |
| 2022.11.25. 16:45 | 14 |
| 2022.11.25. 17:00 | 14 |
| 2022.11.25. 17:15 | 14 |
| 2022.11.25. 17:30 | 14 |
| 2022.11.25. 17:45 | 14 |
| 2022.11.25. 18:00 | 14 |
| 2022.11.25. 18:15 | 14 |
| 2022.11.25. 18:30 | 14 |
| 2022.11.25. 18:45 | 14 |
| 2022.11.25. 19:00 | 14 |
| 2022.11.25. 19:15 | 14 |
| 2022.11.25. 19:30 | 14 |
| 2022.11.25. 19:45 | 14 |
| 2022.11.25. 20:00 | 14 |
| 2022.11.25. 20:15 | 14 |
| 2022.11.25. 20:30 | 14 |
| 2022.11.25. 20:45 | 14 |
| 2022.11.25. 21:00 | 14 |
| 2022.11.25. 21:15 | 14 |
| 2022.11.25. 21:30 | 14 |
| 2022.11.25. 21:45 | 14 |
| 2022.11.25. 22:00 | 14 |
| 2022.11.25. 22:15 | 14 |
| 2022.11.25. 22:30 | 14 |
| 2022.11.25. 22:45 | 14 |
| 2022.11.25. 23:00 | 14 |
| 2022.11.25. 23:15 | 14 |
| 2022.11.25. 23:30 | 14 |
| 2022.11.25. 23:45 | 14 |
| 2022.11.26. 00:00 | 14 |
| 2022.11.26. 00:15 | 14 |
| 2022.11.26. 00:30 | 14 |
| 2022.11.26. 00:45 | 14 |
| 2022.11.26. 01:00 | 14 |
| 2022.11.26. 01:15 | 14 |
| 2022.11.26. 01:30 | 14 |
| 2022.11.26. 01:45 | 14 |
| 2022.11.26. 02:00 | 14 |
| 2022.11.26. 02:15 | 14 |
| 2022.11.26. 02:30 | 14 |
| 2022.11.26. 02:45 | 14 |
| 2022.11.26. 03:00 | 14 |
| 2022.11.26. 03:15 | 14 |
| 2022.11.26. 03:30 | 14 |
| 2022.11.26. 03:45 | 14 |
| 2022.11.26. 04:00 | 14 |
| 2022.11.26. 04:15 | 14 |
| 2022.11.26. 04:30 | 14 |
| 2022.11.26. 04:45 | 14 |
| 2022.11.26. 05:00 | 14 |
| 2022.11.26. 05:15 | 14 |
| 2022.11.26. 05:30 | 14 |
| 2022.11.26. 05:45 | 14 |
| 2022.11.26. 06:00 | 14 |
| 2022.11.26. 06:15 | 14 |
| 2022.11.26. 06:30 | 14 |
| 2022.11.26. 06:45 | 14 |
| 2022.11.26. 07:00 | 14 |
| 2022.11.26. 07:15 | 14 |
| 2022.11.26. 07:30 | 14 |
| 2022.11.26. 07:45 | 14 |
| 2022.11.26. 08:00 | 14 |
| 2022.11.26. 08:15 | 14 |
| 2022.11.26. 08:30 | 14 |
| 2022.11.26. 08:45 | 14 |
| 2022.11.26. 09:00 | 14 |
| 2022.11.26. 09:15 | 14 |
| 2022.11.26. 09:30 | 14 |
| 2022.11.26. 09:45 | 14 |
| 2022.11.26. 10:00 | 14 |
| 2022.11.26. 10:15 | 14 |
| 2022.11.26. 10:30 | 14 |
| 2022.11.26. 10:45 | 14 |
| 2022.11.26. 11:00 | 14 |
| 2022.11.26. 11:15 | 14 |
| 2022.11.26. 11:30 | 14 |
| 2022.11.26. 11:45 | 14 |
| 2022.11.26. 12:00 | 14 |
| 2022.11.26. 12:15 | 14 |
| 2022.11.26. 12:30 | 14 |
| 2022.11.26. 12:45 | 14 |
| 2022.11.26. 13:00 | 14 |
| 2022.11.26. 13:15 | 14 |
| 2022.11.26. 13:30 | 14 |
| 2022.11.26. 13:45 | 14 |
| 2022.11.26. 14:00 | 14 |
| 2022.11.26. 14:15 | 14 |
| 2022.11.26. 14:30 | 14 |
| 2022.11.26. 14:45 | 14 |
| 2022.11.26. 15:00 | 14 |
| 2022.11.26. 15:15 | 14 |
| 2022.11.26. 15:30 | 14 |
| 2022.11.26. 15:45 | 14 |
| 2022.11.26. 16:00 | 14 |
| 2022.11.26. 16:15 | 14 |
| 2022.11.26. 16:30 | 14 |
| 2022.11.26. 16:45 | 14 |
| 2022.11.26. 17:00 | 14 |
| 2022.11.26. 17:15 | 14 |
| 2022.11.26. 17:30 | 14 |
| 2022.11.26. 17:45 | 14 |
| 2022.11.26. 18:00 | 14 |
| 2022.11.26. 18:15 | 14 |
| 2022.11.26. 18:30 | 14 |
| 2022.11.26. 18:45 | 14 |
| 2022.11.26. 19:00 | 14 |
| 2022.11.26. 19:15 | 14 |
| 2022.11.26. 19:30 | 14 |
| 2022.11.26. 19:45 | 14 |
| 2022.11.26. 20:00 | 14 |
| 2022.11.26. 20:15 | 14 |
| 2022.11.26. 20:30 | 14 |
| 2022.11.26. 20:45 | 14 |
| 2022.11.26. 21:00 | 14 |
| 2022.11.26. 21:15 | 14 |
| 2022.11.26. 21:30 | 14 |
| 2022.11.26. 21:45 | 14 |
| 2022.11.26. 22:00 | 14 |
| 2022.11.26. 22:15 | 14 |
| 2022.11.26. 22:30 | 14 |
| 2022.11.26. 22:45 | 14 |
| 2022.11.26. 23:00 | 14 |
| 2022.11.26. 23:15 | 14 |
| 2022.11.26. 23:30 | 14 |
| 2022.11.26. 23:45 | 14 |
| 2022.11.27. 00:00 | 14 |
| 2022.11.27. 00:15 | 14 |
| 2022.11.27. 00:30 | 14 |
| 2022.11.27. 00:45 | 14 |
| 2022.11.27. 01:00 | 14 |
| 2022.11.27. 01:15 | 14 |
| 2022.11.27. 01:30 | 14 |
| 2022.11.27. 01:45 | 14 |
| 2022.11.27. 02:00 | 14 |
| 2022.11.27. 02:15 | 14 |
| 2022.11.27. 02:30 | 14 |
| 2022.11.27. 02:45 | 14 |
| 2022.11.27. 03:00 | 14 |
| 2022.11.27. 03:15 | 14 |
| 2022.11.27. 03:30 | 14 |
| 2022.11.27. 03:45 | 14 |
| 2022.11.27. 04:00 | 14 |
| 2022.11.27. 04:15 | 14 |
| 2022.11.27. 04:30 | 14 |
| 2022.11.27. 04:45 | 14 |
| 2022.11.27. 05:00 | 14 |
| 2022.11.27. 05:15 | 14 |
| 2022.11.27. 05:30 | 14 |
| 2022.11.27. 05:45 | 14 |
| 2022.11.27. 06:00 | 14 |
| 2022.11.27. 06:15 | 14 |
| 2022.11.27. 06:30 | 14 |
| 2022.11.27. 06:45 | 14 |
| 2022.11.27. 07:00 | 14 |
| 2022.11.27. 07:15 | 14 |
| 2022.11.27. 07:30 | 14 |
| 2022.11.27. 07:45 | 14 |
| 2022.11.27. 08:00 | 14 |
| 2022.11.27. 08:15 | 14 |
| 2022.11.27. 08:30 | 14 |
| 2022.11.27. 08:45 | 14 |
| 2022.11.27. 09:00 | 14 |
| 2022.11.27. 09:15 | 14 |
| 2022.11.27. 09:30 | 14 |
| 2022.11.27. 09:45 | 14 |
| 2022.11.27. 10:00 | 14 |
| 2022.11.27. 10:15 | 14 |
| 2022.11.27. 10:30 | 14 |
| 2022.11.27. 10:45 | 14 |
| 2022.11.27. 11:00 | 14 |
| 2022.11.27. 11:15 | 14 |
| 2022.11.27. 11:30 | 14 |
| 2022.11.27. 11:45 | 14 |
| 2022.11.27. 12:00 | 14 |
| 2022.11.27. 12:15 | 14 |
| 2022.11.27. 12:30 | 14 |
| 2022.11.27. 12:45 | 14 |
| 2022.11.27. 13:00 | 14 |
| 2022.11.27. 13:15 | 14 |
| 2022.11.27. 13:30 | 14 |
| 2022.11.27. 13:45 | 14 |
| 2022.11.27. 14:00 | 14 |
| 2022.11.27. 14:15 | 14 |
| 2022.11.27. 14:30 | 14 |
| 2022.11.27. 14:45 | 14 |
| 2022.11.27. 15:00 | 14 |
| 2022.11.27. 15:15 | 14 |
| 2022.11.27. 15:30 | 14 |
| 2022.11.27. 15:45 | 14 |
| 2022.11.27. 16:00 | 14 |
| 2022.11.27. 16:15 | 14 |
| 2022.11.27. 16:30 | 14 |
| 2022.11.27. 16:45 | 14 |
| 2022.11.27. 17:00 | 14 |
| 2022.11.27. 17:15 | 14 |
| 2022.11.27. 17:30 | 14 |
| 2022.11.27. 17:45 | 14 |
| 2022.11.27. 18:00 | 14 |
| 2022.11.27. 18:15 | 14 |
| 2022.11.27. 18:30 | 14 |
| 2022.11.27. 18:45 | 14 |
| 2022.11.27. 19:00 | 14 |
| 2022.11.27. 19:15 | 14 |
| 2022.11.27. 19:30 | 14 |
| 2022.11.27. 19:45 | 14 |
| 2022.11.27. 20:00 | 14 |
| 2022.11.27. 20:15 | 14 |
| 2022.11.27. 20:30 | 14 |
| 2022.11.27. 20:45 | 14 |
| 2022.11.27. 21:00 | 14 |
| 2022.11.27. 21:15 | 14 |
| 2022.11.27. 21:30 | 14 |
| 2022.11.27. 21:45 | 14 |
| 2022.11.27. 22:00 | 14 |
| 2022.11.27. 22:15 | 14 |
| 2022.11.27. 22:30 | 14 |
| 2022.11.27. 22:45 | 14 |
| 2022.11.27. 23:00 | 14 |
| 2022.11.27. 23:15 | 14 |
| 2022.11.27. 23:30 | 14 |
| 2022.11.27. 23:45 | 14 |
| 2022.11.28. 00:00 | 14 |
| 2022.11.28. 00:15 | 14 |
| 2022.11.28. 00:30 | 14 |
| 2022.11.28. 00:45 | 14 |
| 2022.11.28. 01:00 | 14 |
| 2022.11.28. 01:15 | 14 |
| 2022.11.28. 01:30 | 14 |
| 2022.11.28. 01:45 | 14 |
| 2022.11.28. 02:00 | 14 |
| 2022.11.28. 02:15 | 14 |
| 2022.11.28. 02:30 | 14 |
| 2022.11.28. 02:45 | 14 |
| 2022.11.28. 03:00 | 14 |
| 2022.11.28. 03:15 | 14 |
| 2022.11.28. 03:30 | 14 |
| 2022.11.28. 03:45 | 14 |
| 2022.11.28. 04:00 | 14 |
| 2022.11.28. 04:15 | 14 |
| 2022.11.28. 04:30 | 14 |
| 2022.11.28. 04:45 | 14 |
| 2022.11.28. 05:00 | 14 |
| 2022.11.28. 05:15 | 14 |
| 2022.11.28. 05:30 | 14 |
| 2022.11.28. 05:45 | 14 |
| 2022.11.28. 06:00 | 14 |
| 2022.11.28. 06:15 | 14 |
| 2022.11.28. 06:30 | 14 |
| 2022.11.28. 06:45 | 14 |
| 2022.11.28. 07:00 | 14 |
| 2022.11.28. 07:15 | 14 |
| 2022.11.28. 07:30 | 14 |
| 2022.11.28. 07:45 | 14 |
| 2022.11.28. 08:00 | 14 |
| 2022.11.28. 08:15 | 14 |
| 2022.11.28. 08:30 | 14 |
| 2022.11.28. 08:45 | 14 |
| 2022.11.28. 09:00 | 14 |
| 2022.11.28. 09:15 | 14 |
| 2022.11.28. 09:30 | 14 |
| 2022.11.28. 09:45 | 14 |
| 2022.11.28. 10:00 | 14 |
| 2022.11.28. 10:15 | 14 |
| 2022.11.28. 10:30 | 14 |
| 2022.11.28. 10:45 | 14 |
| 2022.11.28. 11:00 | 14 |
| 2022.11.28. 11:15 | 14 |
| 2022.11.28. 11:30 | 14 |
| 2022.11.28. 11:45 | 14 |
| 2022.11.28. 12:00 | 14 |
| 2022.11.28. 12:15 | 14 |
| 2022.11.28. 12:30 | 14 |
| 2022.11.28. 12:45 | 14 |
| 2022.11.28. 13:00 | 14 |
| 2022.11.28. 13:15 | 14 |
| 2022.11.28. 13:30 | 14 |
| 2022.11.28. 13:45 | 14 |
| 2022.11.28. 14:00 | 14 |
| 2022.11.28. 14:15 | 14 |
| 2022.11.28. 14:30 | 14 |
| 2022.11.28. 14:45 | 14 |
| 2022.11.28. 15:00 | 14 |
| 2022.11.28. 15:15 | 14 |
| 2022.11.28. 15:30 | 14 |
| 2022.11.28. 15:45 | 14 |
| 2022.11.28. 16:00 | 14 |
| 2022.11.28. 16:15 | 14 |
| 2022.11.28. 16:30 | 14 |
| 2022.11.28. 16:45 | 14 |
| 2022.11.28. 17:00 | 14 |
| 2022.11.28. 17:15 | 14 |
| 2022.11.28. 17:30 | 14 |
| 2022.11.28. 17:45 | 14 |
| 2022.11.28. 18:00 | 14 |
| 2022.11.28. 18:15 | 14 |
| 2022.11.28. 18:30 | 14 |
| 2022.11.28. 18:45 | 14 |
| 2022.11.28. 19:00 | 14 |
| 2022.11.28. 19:15 | 14 |
| 2022.11.28. 19:30 | 14 |
| 2022.11.28. 19:45 | 14 |
| 2022.11.28. 20:00 | 14 |
| 2022.11.28. 20:15 | 14 |
| 2022.11.28. 20:30 | 14 |
| 2022.11.28. 20:45 | 14 |
| 2022.11.28. 21:00 | 14 |
| 2022.11.28. 21:15 | 14 |
| 2022.11.28. 21:30 | 14 |
| 2022.11.28. 21:45 | 14 |
| 2022.11.28. 22:00 | 14 |
| 2022.11.28. 22:15 | 14 |
| 2022.11.28. 22:30 | 14 |
| 2022.11.28. 22:45 | 14 |
| 2022.11.28. 23:00 | 14 |
| 2022.11.28. 23:15 | 14 |
| 2022.11.28. 23:30 | 14 |
| 2022.11.28. 23:45 | 14 |
| 2022.11.29. 00:00 | 14 |
| 2022.11.29. 00:15 | 14 |
| 2022.11.29. 00:30 | 14 |
| 2022.11.29. 00:45 | 14 |
| 2022.11.29. 01:00 | 14 |
| 2022.11.29. 01:15 | 14 |
| 2022.11.29. 01:30 | 14 |
| 2022.11.29. 01:45 | 14 |
| 2022.11.29. 02:00 | 14 |
| 2022.11.29. 02:15 | 14 |
| 2022.11.29. 02:30 | 14 |
| 2022.11.29. 02:45 | 14 |
| 2022.11.29. 03:00 | 14 |
| 2022.11.29. 03:15 | 14 |
| 2022.11.29. 03:30 | 14 |
| 2022.11.29. 03:45 | 14 |
| 2022.11.29. 04:00 | 14 |
| 2022.11.29. 04:15 | 14 |
| 2022.11.29. 04:30 | 14 |
| 2022.11.29. 04:45 | 14 |
| 2022.11.29. 05:00 | 14 |
| 2022.11.29. 05:15 | 14 |
| 2022.11.29. 05:30 | 14 |
| 2022.11.29. 05:45 | 14 |
| 2022.11.29. 06:00 | 14 |
| 2022.11.29. 06:15 | 14 |
| 2022.11.29. 06:30 | 14 |
| 2022.11.29. 06:45 | 14 |
| 2022.11.29. 07:00 | 14 |
| 2022.11.29. 07:15 | 14 |
| 2022.11.29. 07:30 | 14 |
| 2022.11.29. 07:45 | 14 |
| 2022.11.29. 08:00 | 14 |
| 2022.11.29. 08:15 | 14 |
| 2022.11.29. 08:30 | 14 |
| 2022.11.29. 08:45 | 14 |
| 2022.11.29. 09:00 | 14 |
| 2022.11.29. 09:15 | 14 |
| 2022.11.29. 09:30 | 14 |
| 2022.11.29. 09:45 | 14 |
| 2022.11.29. 10:00 | 14 |
| 2022.11.29. 10:15 | 14 |
| 2022.11.29. 10:30 | 14 |
| 2022.11.29. 10:45 | 14 |
| 2022.11.29. 11:00 | 14 |
| 2022.11.29. 11:15 | 14 |
| 2022.11.29. 11:30 | 14 |
| 2022.11.29. 11:45 | 14 |
| 2022.11.29. 12:00 | 14 |
| 2022.11.29. 12:15 | 14 |
| 2022.11.29. 12:30 | 14 |
| 2022.11.29. 12:45 | 14 |
| 2022.11.29. 13:00 | 14 |
| 2022.11.29. 13:15 | 14 |
| 2022.11.29. 13:30 | 14 |
| 2022.11.29. 13:45 | 14 |
| 2022.11.29. 14:00 | 14 |
| 2022.11.29. 14:15 | 14 |
| 2022.11.29. 14:30 | 14 |
| 2022.11.29. 14:45 | 14 |
| 2022.11.29. 15:00 | 14 |
| 2022.11.29. 15:15 | 14 |
| 2022.11.29. 15:30 | 14 |
| 2022.11.29. 15:45 | 14 |
| 2022.11.29. 16:00 | 14 |
| 2022.11.29. 16:15 | 14 |
| 2022.11.29. 16:30 | 14 |
| 2022.11.29. 16:45 | 14 |
| 2022.11.29. 17:00 | 14 |
| 2022.11.29. 17:15 | 14 |
| 2022.11.29. 17:30 | 14 |
| 2022.11.29. 17:45 | 14 |
| 2022.11.29. 18:00 | 14 |
| 2022.11.29. 18:15 | 14 |
| 2022.11.29. 18:30 | 14 |
| 2022.11.29. 18:45 | 14 |
| 2022.11.29. 19:00 | 14 |
| 2022.11.29. 19:15 | 14 |
| 2022.11.29. 19:30 | 14 |
| 2022.11.29. 19:45 | 14 |
| 2022.11.29. 20:00 | 14 |
| 2022.11.29. 20:15 | 14 |
| 2022.11.29. 20:30 | 14 |
| 2022.11.29. 20:45 | 14 |
| 2022.11.29. 21:00 | 14 |
| 2022.11.29. 21:15 | 14 |
| 2022.11.29. 21:30 | 14 |
| 2022.11.29. 21:45 | 14 |
| 2022.11.29. 22:00 | 14 |
| 2022.11.29. 22:15 | 14 |
| 2022.11.29. 22:30 | 14 |
| 2022.11.29. 22:45 | 14 |
| 2022.11.29. 23:00 | 14 |
| 2022.11.29. 23:15 | 14 |
| 2022.11.29. 23:30 | 14 |
| 2022.11.29. 23:45 | 14 |
| 2022.11.30. 00:00 | 14 |
| 2022.11.30. 00:15 | 14 |
| 2022.11.30. 00:30 | 14 |
| 2022.11.30. 00:45 | 14 |
| 2022.11.30. 01:00 | 14 |
| 2022.11.30. 01:15 | 14 |
| 2022.11.30. 01:30 | 14 |
| 2022.11.30. 01:45 | 14 |
| 2022.11.30. 02:00 | 14 |
| 2022.11.30. 02:15 | 14 |
| 2022.11.30. 02:30 | 14 |
| 2022.11.30. 02:45 | 14 |
| 2022.11.30. 03:00 | 14 |
| 2022.11.30. 03:15 | 14 |
| 2022.11.30. 03:30 | 14 |
| 2022.11.30. 03:45 | 14 |
| 2022.11.30. 04:00 | 14 |
| 2022.11.30. 04:15 | 14 |
| 2022.11.30. 04:30 | 14 |
| 2022.11.30. 04:45 | 14 |
| 2022.11.30. 05:00 | 14 |
| 2022.11.30. 05:15 | 14 |
| 2022.11.30. 05:30 | 14 |
| 2022.11.30. 05:45 | 14 |
| 2022.11.30. 06:00 | 14 |
| 2022.11.30. 06:15 | 14 |
| 2022.11.30. 06:30 | 14 |
| 2022.11.30. 06:45 | 14 |
| 2022.11.30. 07:00 | 14 |
| 2022.11.30. 07:15 | 14 |
| 2022.11.30. 07:30 | 14 |
| 2022.11.30. 07:45 | 14 |
| 2022.11.30. 08:00 | 14 |
| 2022.11.30. 08:15 | 14 |
| 2022.11.30. 08:30 | 14 |
| 2022.11.30. 08:45 | 14 |
| 2022.11.30. 09:00 | 14 |
| 2022.11.30. 09:15 | 14 |
| 2022.11.30. 09:30 | 14 |
| 2022.11.30. 09:45 | 14 |
| 2022.11.30. 10:00 | 14 |
| 2022.11.30. 10:15 | 14 |
| 2022.11.30. 10:30 | 14 |
| 2022.11.30. 10:45 | 14 |
| 2022.11.30. 11:00 | 14 |
| 2022.11.30. 11:15 | 14 |
| 2022.11.30. 11:30 | 14 |
| 2022.11.30. 11:45 | 14 |
| 2022.11.30. 12:00 | 14 |
| 2022.11.30. 12:15 | 14 |
| 2022.11.30. 12:30 | 14 |
| 2022.11.30. 12:45 | 14 |
| 2022.11.30. 13:00 | 14 |
| 2022.11.30. 13:15 | 14 |
| 2022.11.30. 13:30 | 14 |
| 2022.11.30. 13:45 | 14 |
| 2022.11.30. 14:00 | 14 |
| 2022.11.30. 14:15 | 14 |
| 2022.11.30. 14:30 | 14 |
| 2022.11.30. 14:45 | 14 |
| 2022.11.30. 15:00 | 14 |
| 2022.11.30. 15:15 | 14 |
| 2022.11.30. 15:30 | 14 |
| 2022.11.30. 15:45 | 14 |
| 2022.11.30. 16:00 | 14 |
| 2022.11.30. 16:15 | 14 |
| 2022.11.30. 16:30 | 14 |
| 2022.11.30. 16:45 | 14 |
| 2022.11.30. 17:00 | 14 |
| 2022.11.30. 17:15 | 14 |
| 2022.11.30. 17:30 | 14 |
| 2022.11.30. 17:45 | 14 |
| 2022.11.30. 18:00 | 14 |
| 2022.11.30. 18:15 | 14 |
| 2022.11.30. 18:30 | 14 |
| 2022.11.30. 18:45 | 14 |
| 2022.11.30. 19:00 | 14 |
| 2022.11.30. 19:15 | 14 |
| 2022.11.30. 19:30 | 14 |
| 2022.11.30. 19:45 | 14 |
| 2022.11.30. 20:00 | 14 |
| 2022.11.30. 20:15 | 14 |
| 2022.11.30. 20:30 | 14 |
| 2022.11.30. 20:45 | 14 |
| 2022.11.30. 21:00 | 14 |
| 2022.11.30. 21:15 | 14 |
| 2022.11.30. 21:30 | 14 |
| 2022.11.30. 21:45 | 14 |
| 2022.11.30. 22:00 | 14 |
| 2022.11.30. 22:15 | 14 |
| 2022.11.30. 22:30 | 14 |
| 2022.11.30. 22:45 | 14 |
| 2022.11.30. 23:00 | 14 |
| 2022.11.30. 23:15 | 14 |
| 2022.11.30. 23:30 | 14 |
| 2022.11.30. 23:45 | 14 |
| 2022.12.01. 00:00 | 14 |
| 2022.12.01. 00:15 | 14 |
| 2022.12.01. 00:30 | 14 |
| 2022.12.01. 00:45 | 14 |
| 2022.12.01. 01:00 | 14 |
| 2022.12.01. 01:15 | 14 |
| 2022.12.01. 01:30 | 14 |
| 2022.12.01. 01:45 | 14 |
| 2022.12.01. 02:00 | 14 |
| 2022.12.01. 02:15 | 14 |
| 2022.12.01. 02:30 | 14 |
| 2022.12.01. 02:45 | 14 |
| 2022.12.01. 03:00 | 14 |
| 2022.12.01. 03:15 | 14 |
| 2022.12.01. 03:30 | 14 |
| 2022.12.01. 03:45 | 14 |
| 2022.12.01. 04:00 | 14 |
| 2022.12.01. 04:15 | 14 |
| 2022.12.01. 04:30 | 14 |
| 2022.12.01. 04:45 | 14 |
| 2022.12.01. 05:00 | 14 |
| 2022.12.01. 05:15 | 14 |
| 2022.12.01. 05:30 | 14 |
| 2022.12.01. 05:45 | 14 |
| 2022.12.01. 06:00 | 14 |
| 2022.12.01. 06:15 | 14 |
| 2022.12.01. 06:30 | 14 |
| 2022.12.01. 06:45 | 14 |
| 2022.12.01. 07:00 | 14 |
| 2022.12.01. 07:15 | 14 |
| 2022.12.01. 07:30 | 14 |
| 2022.12.01. 07:45 | 14 |
| 2022.12.01. 08:00 | 14 |
| 2022.12.01. 08:15 | 14 |
| 2022.12.01. 08:30 | 14 |
| 2022.12.01. 08:45 | 14 |
| 2022.12.01. 09:00 | 14 |
| 2022.12.01. 09:15 | 14 |
| 2022.12.01. 09:30 | 14 |
| 2022.12.01. 09:45 | 14 |
| 2022.12.01. 10:00 | 14 |
| 2022.12.01. 10:15 | 14 |
| 2022.12.01. 10:30 | 14 |
| 2022.12.01. 10:45 | 14 |
| 2022.12.01. 11:00 | 14 |
| 2022.12.01. 11:15 | 14 |
| 2022.12.01. 11:30 | 14 |
| 2022.12.01. 11:45 | 14 |
| 2022.12.01. 12:00 | 14 |
| 2022.12.01. 12:15 | 14 |
| 2022.12.01. 12:30 | 14 |
| 2022.12.01. 12:45 | 14 |
| 2022.12.01. 13:00 | 14 |
| 2022.12.01. 13:15 | 14 |
| 2022.12.01. 13:30 | 14 |
| 2022.12.01. 13:45 | 14 |
| 2022.12.01. 14:00 | 14 |
| 2022.12.01. 14:15 | 14 |
| 2022.12.01. 14:30 | 14 |
| 2022.12.01. 14:45 | 14 |
| 2022.12.01. 15:00 | 14 |
| 2022.12.01. 15:15 | 14 |
| 2022.12.01. 15:30 | 14 |
| 2022.12.01. 15:45 | 14 |
| 2022.12.01. 16:00 | 14 |
| 2022.12.01. 16:15 | 14 |
| 2022.12.01. 16:30 | 14 |
| 2022.12.01. 16:45 | 14 |
| 2022.12.01. 17:00 | 14 |
| 2022.12.01. 17:15 | 14 |
| 2022.12.01. 17:30 | 14 |
| 2022.12.01. 17:45 | 14 |
| 2022.12.01. 18:00 | 14 |
| 2022.12.01. 18:15 | 14 |
| 2022.12.01. 18:30 | 14 |
| 2022.12.01. 18:45 | 14 |
| 2022.12.01. 19:00 | 14 |
| 2022.12.01. 19:15 | 14 |
| 2022.12.01. 19:30 | 14 |
| 2022.12.01. 19:45 | 14 |
| 2022.12.01. 20:00 | 14 |
| 2022.12.01. 20:15 | 14 |
| 2022.12.01. 20:30 | 14 |
| 2022.12.01. 20:45 | 14 |
| 2022.12.01. 21:00 | 14 |
| 2022.12.01. 21:15 | 14 |
| 2022.12.01. 21:30 | 14 |
| 2022.12.01. 21:45 | 14 |
| 2022.12.01. 22:00 | 14 |
| 2022.12.01. 22:15 | 14 |
| 2022.12.01. 22:30 | 14 |
| 2022.12.01. 22:45 | 14 |
| 2022.12.01. 23:00 | 14 |
| 2022.12.01. 23:15 | 14 |
| 2022.12.01. 23:30 | 14 |
| 2022.12.01. 23:45 | 14 |
| 2022.12.02. 00:00 | 14 |
| 2022.12.02. 00:15 | 14 |
| 2022.12.02. 00:30 | 14 |
| 2022.12.02. 00:45 | 14 |
| 2022.12.02. 01:00 | 14 |
| 2022.12.02. 01:15 | 14 |
| 2022.12.02. 01:30 | 14 |
| 2022.12.02. 01:45 | 14 |
| 2022.12.02. 02:00 | 14 |
| 2022.12.02. 02:15 | 14 |
| 2022.12.02. 02:30 | 14 |
| 2022.12.02. 02:45 | 14 |
| 2022.12.02. 03:00 | 14 |
| 2022.12.02. 03:15 | 14 |
| 2022.12.02. 03:30 | 14 |
| 2022.12.02. 03:45 | 14 |
| 2022.12.02. 04:00 | 14 |
| 2022.12.02. 04:15 | 14 |
| 2022.12.02. 04:30 | 14 |
| 2022.12.02. 04:45 | 14 |
| 2022.12.02. 05:00 | 14 |
| 2022.12.02. 05:15 | 14 |
| 2022.12.02. 05:30 | 14 |
| 2022.12.02. 05:45 | 14 |
| 2022.12.02. 06:00 | 14 |
| 2022.12.02. 06:15 | 14 |
| 2022.12.02. 06:30 | 14 |
| 2022.12.02. 06:45 | 14 |
| 2022.12.02. 07:00 | 14 |
| 2022.12.02. 07:15 | 14 |
| 2022.12.02. 07:30 | 14 |
| 2022.12.02. 07:45 | 14 |
| 2022.12.02. 08:00 | 14 |
| 2022.12.02. 08:15 | 14 |
| 2022.12.02. 08:30 | 14 |
| 2022.12.02. 08:45 | 14 |
| 2022.12.02. 09:00 | 14 |
| 2022.12.02. 09:15 | 14 |
| 2022.12.02. 09:30 | 14 |
| 2022.12.02. 09:45 | 14 |
| 2022.12.02. 10:00 | 14 |
| 2022.12.02. 10:15 | 14 |
| 2022.12.02. 10:30 | 14 |
| 2022.12.02. 10:45 | 14 |
| 2022.12.02. 11:00 | 14 |
| 2022.12.02. 11:15 | 14 |
| 2022.12.02. 11:30 | 14 |
| 2022.12.02. 11:45 | 14 |
| 2022.12.02. 12:00 | 14 |
| 2022.12.02. 12:15 | 14 |
| 2022.12.02. 12:30 | 14 |
| 2022.12.02. 12:45 | 14 |
| 2022.12.02. 13:00 | 14 |
| 2022.12.02. 13:15 | 14 |
| 2022.12.02. 13:30 | 14 |
| 2022.12.02. 13:45 | 14 |
| 2022.12.02. 14:00 | 14 |
| 2022.12.02. 14:15 | 14 |
| 2022.12.02. 14:30 | 14 |
| 2022.12.02. 14:45 | 14 |
| 2022.12.02. 15:00 | 14 |
| 2022.12.02. 15:15 | 14 |
| 2022.12.02. 15:30 | 14 |
| 2022.12.02. 15:45 | 14 |
| 2022.12.02. 16:00 | 14 |
| 2022.12.02. 16:15 | 14 |
| 2022.12.02. 16:30 | 14 |
| 2022.12.02. 16:45 | 14 |
| 2022.12.02. 17:00 | 14 |
| 2022.12.02. 17:15 | 14 |
| 2022.12.02. 17:30 | 14 |
| 2022.12.02. 17:45 | 14 |
| 2022.12.02. 18:00 | 14 |
| 2022.12.02. 18:15 | 14 |
| 2022.12.02. 18:30 | 14 |
| 2022.12.02. 18:45 | 14 |
| 2022.12.02. 19:00 | 14 |
| 2022.12.02. 19:15 | 14 |
| 2022.12.02. 19:30 | 14 |
| 2022.12.02. 19:45 | 14 |
| 2022.12.02. 20:00 | 14 |
| 2022.12.02. 20:15 | 14 |
| 2022.12.02. 20:30 | 14 |
| 2022.12.02. 20:45 | 14 |
| 2022.12.02. 21:00 | 14 |
| 2022.12.02. 21:15 | 14 |
| 2022.12.02. 21:30 | 14 |
| 2022.12.02. 21:45 | 14 |
| 2022.12.02. 22:00 | 14 |
| 2022.12.02. 22:15 | 14 |
| 2022.12.02. 22:30 | 14 |
| 2022.12.02. 22:45 | 14 |
| 2022.12.02. 23:00 | 14 |
| 2022.12.02. 23:15 | 14 |
| 2022.12.02. 23:30 | 14 |
| 2022.12.02. 23:45 | 14 |
| 2022.12.03. 00:00 | 14 |
| 2022.12.03. 00:15 | 14 |
| 2022.12.03. 00:30 | 14 |
| 2022.12.03. 00:45 | 14 |
| 2022.12.03. 01:00 | 14 |
| 2022.12.03. 01:15 | 14 |
| 2022.12.03. 01:30 | 14 |
| 2022.12.03. 01:45 | 14 |
| 2022.12.03. 02:00 | 14 |
| 2022.12.03. 02:15 | 14 |
| 2022.12.03. 02:30 | 14 |
| 2022.12.03. 02:45 | 14 |
| 2022.12.03. 03:00 | 14 |
| 2022.12.03. 03:15 | 14 |
| 2022.12.03. 03:30 | 14 |
| 2022.12.03. 03:45 | 14 |
| 2022.12.03. 04:00 | 14 |
| 2022.12.03. 04:15 | 14 |
| 2022.12.03. 04:30 | 14 |
| 2022.12.03. 04:45 | 14 |
| 2022.12.03. 05:00 | 14 |
| 2022.12.03. 05:15 | 14 |
| 2022.12.03. 05:30 | 14 |
| 2022.12.03. 05:45 | 14 |
| 2022.12.03. 06:00 | 14 |
| 2022.12.03. 06:15 | 14 |
| 2022.12.03. 06:30 | 14 |
| 2022.12.03. 06:45 | 14 |
| 2022.12.03. 07:00 | 14 |
| 2022.12.03. 07:15 | 14 |
| 2022.12.03. 07:30 | 14 |
| 2022.12.03. 07:45 | 14 |
| 2022.12.03. 08:00 | 14 |
| 2022.12.03. 08:15 | 14 |
| 2022.12.03. 08:30 | 14 |
| 2022.12.03. 08:45 | 14 |
| 2022.12.03. 09:00 | 14 |
| 2022.12.03. 09:15 | 14 |
| 2022.12.03. 09:30 | 14 |
| 2022.12.03. 09:45 | 14 |
| 2022.12.03. 10:00 | 14 |
| 2022.12.03. 10:15 | 14 |
| 2022.12.03. 10:30 | 14 |
| 2022.12.03. 10:45 | 14 |
| 2022.12.03. 11:00 | 14 |
| 2022.12.03. 11:15 | 14 |
| 2022.12.03. 11:30 | 14 |
| 2022.12.03. 11:45 | 14 |
| 2022.12.03. 12:00 | 14 |
| 2022.12.03. 12:15 | 14 |
| 2022.12.03. 12:30 | 14 |
| 2022.12.03. 12:45 | 14 |
| 2022.12.03. 13:00 | 14 |
| 2022.12.03. 13:15 | 14 |
| 2022.12.03. 13:30 | 14 |
| 2022.12.03. 13:45 | 14 |
| 2022.12.03. 14:00 | 14 |
| 2022.12.03. 14:15 | 14 |
| 2022.12.03. 14:30 | 14 |
| 2022.12.03. 14:45 | 14 |
| 2022.12.03. 15:00 | 14 |
| 2022.12.03. 15:15 | 14 |
| 2022.12.03. 15:30 | 14 |
| 2022.12.03. 15:45 | 14 |
| 2022.12.03. 16:00 | 14 |
| 2022.12.03. 16:15 | 14 |
| 2022.12.03. 16:30 | 14 |
| 2022.12.03. 16:45 | 14 |
| 2022.12.03. 17:00 | 14 |
| 2022.12.03. 17:15 | 14 |
| 2022.12.03. 17:30 | 14 |
| 2022.12.03. 17:45 | 14 |
| 2022.12.03. 18:00 | 14 |
| 2022.12.03. 18:15 | 14 |
| 2022.12.03. 18:30 | 14 |
| 2022.12.03. 18:45 | 14 |
| 2022.12.03. 19:00 | 14 |
| 2022.12.03. 19:15 | 14 |
| 2022.12.03. 19:30 | 14 |
| 2022.12.03. 19:45 | 14 |
| 2022.12.03. 20:00 | 14 |
| 2022.12.03. 20:15 | 14 |
| 2022.12.03. 20:30 | 14 |
| 2022.12.03. 20:45 | 14 |
| 2022.12.03. 21:00 | 14 |
| 2022.12.03. 21:15 | 14 |
| 2022.12.03. 21:30 | 14 |
| 2022.12.03. 21:45 | 14 |
| 2022.12.03. 22:00 | 14 |
| 2022.12.03. 22:15 | 14 |
| 2022.12.03. 22:30 | 14 |
| 2022.12.03. 22:45 | 14 |
| 2022.12.03. 23:00 | 14 |
| 2022.12.03. 23:15 | 14 |
| 2022.12.03. 23:30 | 14 |
| 2022.12.03. 23:45 | 14 |
| 2022.12.04. 00:00 | 14 |
| 2022.12.04. 00:15 | 14 |
| 2022.12.04. 00:30 | 14 |
| 2022.12.04. 00:45 | 14 |
| 2022.12.04. 01:00 | 14 |
| 2022.12.04. 01:15 | 14 |
| 2022.12.04. 01:30 | 14 |
| 2022.12.04. 01:45 | 14 |
| 2022.12.04. 02:00 | 14 |
| 2022.12.04. 02:15 | 14 |
| 2022.12.04. 02:30 | 14 |
| 2022.12.04. 02:45 | 14 |
| 2022.12.04. 03:00 | 14 |
| 2022.12.04. 03:15 | 14 |
| 2022.12.04. 03:30 | 14 |
| 2022.12.04. 03:45 | 14 |
| 2022.12.04. 04:00 | 14 |
| 2022.12.04. 04:15 | 14 |
| 2022.12.04. 04:30 | 14 |
| 2022.12.04. 04:45 | 14 |
| 2022.12.04. 05:00 | 14 |
| 2022.12.04. 05:15 | 14 |
| 2022.12.04. 05:30 | 14 |
| 2022.12.04. 05:45 | 14 |
| 2022.12.04. 06:00 | 14 |
| 2022.12.04. 06:15 | 14 |
| 2022.12.04. 06:30 | 14 |
| 2022.12.04. 06:45 | 14 |
| 2022.12.04. 07:00 | 14 |
| 2022.12.04. 07:15 | 14 |
| 2022.12.04. 07:30 | 14 |
| 2022.12.04. 07:45 | 14 |
| 2022.12.04. 08:00 | 14 |
| 2022.12.04. 08:15 | 14 |
| 2022.12.04. 08:30 | 14 |
| 2022.12.04. 08:45 | 14 |
| 2022.12.04. 09:00 | 14 |
| 2022.12.04. 09:15 | 14 |
| 2022.12.04. 09:30 | 14 |
| 2022.12.04. 09:45 | 14 |
| 2022.12.04. 10:00 | 14 |
| 2022.12.04. 10:15 | 14 |
| 2022.12.04. 10:30 | 14 |
| 2022.12.04. 10:45 | 14 |
| 2022.12.04. 11:00 | 14 |
| 2022.12.04. 11:15 | 14 |
| 2022.12.04. 11:30 | 14 |
| 2022.12.04. 11:45 | 14 |
| 2022.12.04. 12:00 | 14 |
| 2022.12.04. 12:15 | 14 |
| 2022.12.04. 12:30 | 14 |
| 2022.12.04. 12:45 | 14 |
| 2022.12.04. 13:00 | 14 |
| 2022.12.04. 13:15 | 14 |
| 2022.12.04. 13:30 | 14 |
| 2022.12.04. 13:45 | 14 |
| 2022.12.04. 14:00 | 14 |
| 2022.12.04. 14:15 | 14 |
| 2022.12.04. 14:30 | 14 |
| 2022.12.04. 14:45 | 14 |
| 2022.12.04. 15:00 | 14 |
| 2022.12.04. 15:15 | 14 |
| 2022.12.04. 15:30 | 14 |
| 2022.12.04. 15:45 | 14 |
| 2022.12.04. 16:00 | 14 |
| 2022.12.04. 16:15 | 14 |
| 2022.12.04. 16:30 | 14 |
| 2022.12.04. 16:45 | 14 |
| 2022.12.04. 17:00 | 14 |
| 2022.12.04. 17:15 | 14 |
| 2022.12.04. 17:30 | 14 |
| 2022.12.04. 17:45 | 14 |
| 2022.12.04. 18:00 | 14 |
| 2022.12.04. 18:15 | 14 |
| 2022.12.04. 18:30 | 14 |
| 2022.12.04. 18:45 | 14 |
| 2022.12.04. 19:00 | 14 |
| 2022.12.04. 19:15 | 14 |
| 2022.12.04. 19:30 | 14 |
| 2022.12.04. 19:45 | 14 |
| 2022.12.04. 20:00 | 14 |
| 2022.12.04. 20:15 | 14 |
| 2022.12.04. 20:30 | 14 |
| 2022.12.04. 20:45 | 14 |
| 2022.12.04. 21:00 | 14 |
| 2022.12.04. 21:15 | 14 |
| 2022.12.04. 21:30 | 14 |
| 2022.12.04. 21:45 | 14 |
| 2022.12.04. 22:00 | 14 |
| 2022.12.04. 22:15 | 14 |
| 2022.12.04. 22:30 | 14 |
| 2022.12.04. 22:45 | 14 |
| 2022.12.04. 23:00 | 14 |
| 2022.12.04. 23:15 | 14 |
| 2022.12.04. 23:30 | 14 |
| 2022.12.04. 23:45 | 14 |
| 2022.12.05. 00:00 | 14 |
| 2022.12.05. 00:15 | 14 |
| 2022.12.05. 00:30 | 14 |
| 2022.12.05. 00:45 | 14 |
| 2022.12.05. 01:00 | 14 |
| 2022.12.05. 01:15 | 14 |
| 2022.12.05. 01:30 | 14 |
| 2022.12.05. 01:45 | 14 |
| 2022.12.05. 02:00 | 14 |
| 2022.12.05. 02:15 | 14 |
| 2022.12.05. 02:30 | 14 |
| 2022.12.05. 02:45 | 14 |
| 2022.12.05. 03:00 | 14 |
| 2022.12.05. 03:15 | 14 |
| 2022.12.05. 03:30 | 14 |
| 2022.12.05. 03:45 | 14 |
| 2022.12.05. 04:00 | 14 |
| 2022.12.05. 04:15 | 14 |
| 2022.12.05. 04:30 | 14 |
| 2022.12.05. 04:45 | 14 |
| 2022.12.05. 05:00 | 14 |
| 2022.12.05. 05:15 | 14 |
| 2022.12.05. 05:30 | 14 |
| 2022.12.05. 05:45 | 14 |
| 2022.12.05. 06:00 | 14 |
| 2022.12.05. 06:15 | 14 |
| 2022.12.05. 06:30 | 14 |
| 2022.12.05. 06:45 | 14 |
| 2022.12.05. 07:00 | 14 |
| 2022.12.05. 07:15 | 14 |
| 2022.12.05. 07:30 | 14 |
| 2022.12.05. 07:45 | 14 |
| 2022.12.05. 08:00 | 14 |
| 2022.12.05. 08:15 | 14 |
| 2022.12.05. 08:30 | 14 |
| 2022.12.05. 08:45 | 14 |
| 2022.12.05. 09:00 | 14 |
| 2022.12.05. 09:15 | 14 |
| 2022.12.05. 09:30 | 14 |
| 2022.12.05. 09:45 | 14 |
| 2022.12.05. 10:00 | 14 |
| 2022.12.05. 10:15 | 14 |
| 2022.12.05. 10:30 | 14 |
| 2022.12.05. 10:45 | 14 |
| 2022.12.05. 11:00 | 14 |
| 2022.12.05. 11:15 | 14 |
| 2022.12.05. 11:30 | 14 |
| 2022.12.05. 11:45 | 14 |
| 2022.12.05. 12:00 | 14 |
| 2022.12.05. 12:15 | 14 |
| 2022.12.05. 12:30 | 14 |
| 2022.12.05. 12:45 | 14 |
| 2022.12.05. 13:00 | 14 |
| 2022.12.05. 13:15 | 14 |
| 2022.12.05. 13:30 | 14 |
| 2022.12.05. 13:45 | 14 |
| 2022.12.05. 14:00 | 14 |
| 2022.12.05. 14:15 | 14 |
| 2022.12.05. 14:30 | 14 |
| 2022.12.05. 14:45 | 14 |
| 2022.12.05. 15:00 | 14 |
| 2022.12.05. 15:15 | 14 |
| 2022.12.05. 15:30 | 14 |
| 2022.12.05. 15:45 | 14 |
| 2022.12.05. 16:00 | 14 |
| 2022.12.05. 16:15 | 14 |
| 2022.12.05. 16:30 | 14 |
| 2022.12.05. 16:45 | 14 |
| 2022.12.05. 17:00 | 14 |
| 2022.12.05. 17:15 | 14 |
| 2022.12.05. 17:30 | 14 |
| 2022.12.05. 17:45 | 14 |
| 2022.12.05. 18:00 | 14 |
| 2022.12.05. 18:15 | 14 |
| 2022.12.05. 18:30 | 14 |
| 2022.12.05. 18:45 | 14 |
| 2022.12.05. 19:00 | 14 |
| 2022.12.05. 19:15 | 14 |
| 2022.12.05. 19:30 | 14 |
| 2022.12.05. 19:45 | 14 |
| 2022.12.05. 20:00 | 14 |
| 2022.12.05. 20:15 | 14 |
| 2022.12.05. 20:30 | 14 |
| 2022.12.05. 20:45 | 14 |
| 2022.12.05. 21:00 | 14 |
| 2022.12.05. 21:15 | 14 |
| 2022.12.05. 21:30 | 14 |
| 2022.12.05. 21:45 | 14 |
| 2022.12.05. 22:00 | 14 |
| 2022.12.05. 22:15 | 14 |
| 2022.12.05. 22:30 | 14 |
| 2022.12.05. 22:45 | 14 |
| 2022.12.05. 23:00 | 14 |
| 2022.12.05. 23:15 | 14 |
| 2022.12.05. 23:30 | 14 |
| 2022.12.05. 23:45 | 14 |
| 2022.12.06. 00:00 | 14 |
| 2022.12.06. 00:15 | 14 |
| 2022.12.06. 00:30 | 14 |
| 2022.12.06. 00:45 | 14 |
| 2022.12.06. 01:00 | 14 |
| 2022.12.06. 01:15 | 14 |
| 2022.12.06. 01:30 | 14 |
| 2022.12.06. 01:45 | 14 |
| 2022.12.06. 02:00 | 14 |
| 2022.12.06. 02:15 | 14 |
| 2022.12.06. 02:30 | 14 |
| 2022.12.06. 02:45 | 14 |
| 2022.12.06. 03:00 | 14 |
| 2022.12.06. 03:15 | 14 |
| 2022.12.06. 03:30 | 14 |
| 2022.12.06. 03:45 | 14 |
| 2022.12.06. 04:00 | 14 |
| 2022.12.06. 04:15 | 14 |
| 2022.12.06. 04:30 | 14 |
| 2022.12.06. 04:45 | 14 |
| 2022.12.06. 05:00 | 14 |
| 2022.12.06. 05:15 | 14 |
| 2022.12.06. 05:30 | 14 |
| 2022.12.06. 05:45 | 14 |
| 2022.12.06. 06:00 | 14 |
| 2022.12.06. 06:15 | 14 |
| 2022.12.06. 06:30 | 14 |
| 2022.12.06. 06:45 | 14 |
| 2022.12.06. 07:00 | 14 |
| 2022.12.06. 07:15 | 14 |
| 2022.12.06. 07:30 | 14 |
| 2022.12.06. 07:45 | 14 |
| 2022.12.06. 08:00 | 14 |
| 2022.12.06. 08:15 | 14 |
| 2022.12.06. 08:30 | 14 |
| 2022.12.06. 08:45 | 14 |
| 2022.12.06. 09:00 | 14 |
| 2022.12.06. 09:15 | 14 |
| 2022.12.06. 09:30 | 14 |
| 2022.12.06. 09:45 | 14 |
| 2022.12.06. 10:00 | 14 |
| 2022.12.06. 10:15 | 14 |
| 2022.12.06. 10:30 | 14 |
| 2022.12.06. 10:45 | 14 |
| 2022.12.06. 11:00 | 14 |
| 2022.12.06. 11:15 | 14 |
| 2022.12.06. 11:30 | 14 |
| 2022.12.06. 11:45 | 14 |
| 2022.12.06. 12:00 | 14 |
| 2022.12.06. 12:15 | 14 |
| 2022.12.06. 12:30 | 14 |
| 2022.12.06. 12:45 | 14 |
| 2022.12.06. 13:00 | 14 |
| 2022.12.06. 13:15 | 14 |
| 2022.12.06. 13:30 | 14 |
| 2022.12.06. 13:45 | 14 |
| 2022.12.06. 14:00 | 14 |
| 2022.12.06. 14:15 | 14 |
| 2022.12.06. 14:30 | 14 |
| 2022.12.06. 14:45 | 14 |
| 2022.12.06. 15:00 | 14 |
| 2022.12.06. 15:15 | 14 |
| 2022.12.06. 15:30 | 14 |
| 2022.12.06. 15:45 | 14 |
| 2022.12.06. 16:00 | 14 |
| 2022.12.06. 16:15 | 14 |
| 2022.12.06. 16:30 | 14 |
| 2022.12.06. 16:45 | 14 |
| 2022.12.06. 17:00 | 14 |
| 2022.12.06. 17:15 | 14 |
| 2022.12.06. 17:30 | 14 |
| 2022.12.06. 17:45 | 14 |
| 2022.12.06. 18:00 | 14 |
| 2022.12.06. 18:15 | 14 |
| 2022.12.06. 18:30 | 14 |
| 2022.12.06. 18:45 | 14 |
| 2022.12.06. 19:00 | 14 |
| 2022.12.06. 19:15 | 14 |
| 2022.12.06. 19:30 | 14 |
| 2022.12.06. 19:45 | 14 |
| 2022.12.06. 20:00 | 14 |
| 2022.12.06. 20:15 | 14 |
| 2022.12.06. 20:30 | 14 |
| 2022.12.06. 20:45 | 14 |
| 2022.12.06. 21:00 | 14 |
| 2022.12.06. 21:15 | 14 |
| 2022.12.06. 21:30 | 14 |
| 2022.12.06. 21:45 | 14 |
| 2022.12.06. 22:00 | 14 |
| 2022.12.06. 22:15 | 14 |
| 2022.12.06. 22:30 | 14 |
| 2022.12.06. 22:45 | 14 |
| 2022.12.06. 23:00 | 14 |
| 2022.12.06. 23:15 | 14 |
| 2022.12.06. 23:30 | 14 |
| 2022.12.06. 23:45 | 14 |
| 2022.12.07. 00:00 | 14 |
| 2022.12.07. 00:15 | 14 |
| 2022.12.07. 00:30 | 14 |
| 2022.12.07. 00:45 | 14 |
| 2022.12.07. 01:00 | 14 |
| 2022.12.07. 01:15 | 14 |
| 2022.12.07. 01:30 | 14 |
| 2022.12.07. 01:45 | 14 |
| 2022.12.07. 02:00 | 14 |
| 2022.12.07. 02:15 | 14 |
| 2022.12.07. 02:30 | 14 |
| 2022.12.07. 02:45 | 14 |
| 2022.12.07. 03:00 | 14 |
| 2022.12.07. 03:15 | 14 |
| 2022.12.07. 03:30 | 14 |
| 2022.12.07. 03:45 | 14 |
| 2022.12.07. 04:00 | 14 |
| 2022.12.07. 04:15 | 14 |
| 2022.12.07. 04:30 | 14 |
| 2022.12.07. 04:45 | 14 |
| 2022.12.07. 05:00 | 14 |
| 2022.12.07. 05:15 | 14 |
| 2022.12.07. 05:30 | 14 |
| 2022.12.07. 05:45 | 14 |
| 2022.12.07. 06:00 | 14 |
| 2022.12.07. 06:15 | 14 |
| 2022.12.07. 06:30 | 14 |
| 2022.12.07. 06:45 | 14 |
| 2022.12.07. 07:00 | 14 |
| 2022.12.07. 07:15 | 14 |
| 2022.12.07. 07:30 | 14 |
| 2022.12.07. 07:45 | 14 |
| 2022.12.07. 08:00 | 14 |
| 2022.12.07. 08:15 | 14 |
| 2022.12.07. 08:30 | 14 |
| 2022.12.07. 08:45 | 14 |
| 2022.12.07. 09:00 | 14 |
| 2022.12.07. 09:15 | 14 |
| 2022.12.07. 09:30 | 14 |
| 2022.12.07. 09:45 | 14 |
| 2022.12.07. 10:00 | 14 |
| 2022.12.07. 10:15 | 14 |
| 2022.12.07. 10:30 | 14 |
| 2022.12.07. 10:45 | 14 |
| 2022.12.07. 11:00 | 14 |
| 2022.12.07. 11:15 | 14 |
| 2022.12.07. 11:30 | 14 |
| 2022.12.07. 11:45 | 14 |
| 2022.12.07. 12:00 | 14 |
| 2022.12.07. 12:15 | 14 |
| 2022.12.07. 12:30 | 14 |
| 2022.12.07. 12:45 | 14 |
| 2022.12.07. 13:00 | 14 |
| 2022.12.07. 13:15 | 14 |
| 2022.12.07. 13:30 | 14 |
| 2022.12.07. 13:45 | 14 |
| 2022.12.07. 14:00 | 14 |
| 2022.12.07. 14:15 | 14 |
| 2022.12.07. 14:30 | 14 |
| 2022.12.07. 14:45 | 14 |
| 2022.12.07. 15:00 | 14 |
| 2022.12.07. 15:15 | 14 |
| 2022.12.07. 15:30 | 14 |
| 2022.12.07. 15:45 | 14 |
| 2022.12.07. 16:00 | 14 |
| 2022.12.07. 16:15 | 14 |
| 2022.12.07. 16:30 | 14 |
| 2022.12.07. 16:45 | 14 |
| 2022.12.07. 17:00 | 14 |
| 2022.12.07. 17:15 | 14 |
| 2022.12.07. 17:30 | 14 |
| 2022.12.07. 17:45 | 14 |
| 2022.12.07. 18:00 | 14 |
| 2022.12.07. 18:15 | 14 |
| 2022.12.07. 18:30 | 14 |
| 2022.12.07. 18:45 | 14 |
| 2022.12.07. 19:00 | 14 |
| 2022.12.07. 19:15 | 14 |
| 2022.12.07. 19:30 | 14 |
| 2022.12.07. 19:45 | 14 |
| 2022.12.07. 20:00 | 14 |
| 2022.12.07. 20:15 | 14 |
| 2022.12.07. 20:30 | 14 |
| 2022.12.07. 20:45 | 14 |
| 2022.12.07. 21:00 | 14 |
| 2022.12.07. 21:15 | 14 |
| 2022.12.07. 21:30 | 14 |
| 2022.12.07. 21:45 | 14 |
| 2022.12.07. 22:00 | 14 |
| 2022.12.07. 22:15 | 14 |
| 2022.12.07. 22:30 | 14 |
| 2022.12.07. 22:45 | 14 |
| 2022.12.07. 23:00 | 14 |
| 2022.12.07. 23:15 | 14 |
| 2022.12.07. 23:30 | 14 |
| 2022.12.07. 23:45 | 14 |
| 2022.12.08. 00:00 | 14 |
| 2022.12.08. 00:15 | 14 |
| 2022.12.08. 00:30 | 14 |
| 2022.12.08. 00:45 | 14 |
| 2022.12.08. 01:00 | 14 |
| 2022.12.08. 01:15 | 14 |
| 2022.12.08. 01:30 | 14 |
| 2022.12.08. 01:45 | 14 |
| 2022.12.08. 02:00 | 14 |
| 2022.12.08. 02:15 | 14 |
| 2022.12.08. 02:30 | 14 |
| 2022.12.08. 02:45 | 14 |
| 2022.12.08. 03:00 | 14 |
| 2022.12.08. 03:15 | 14 |
| 2022.12.08. 03:30 | 14 |
| 2022.12.08. 03:45 | 14 |
| 2022.12.08. 04:00 | 14 |
| 2022.12.08. 04:15 | 14 |
| 2022.12.08. 04:30 | 14 |
| 2022.12.08. 04:45 | 14 |
| 2022.12.08. 05:00 | 14 |
| 2022.12.08. 05:15 | 14 |
| 2022.12.08. 05:30 | 14 |
| 2022.12.08. 05:45 | 14 |
| 2022.12.08. 06:00 | 14 |
| 2022.12.08. 06:15 | 14 |
| 2022.12.08. 06:30 | 14 |
| 2022.12.08. 06:45 | 14 |
| 2022.12.08. 07:00 | 14 |
| 2022.12.08. 07:15 | 14 |
| 2022.12.08. 07:30 | 14 |
| 2022.12.08. 07:45 | 14 |
| 2022.12.08. 08:00 | 14 |
| 2022.12.08. 08:15 | 14 |
| 2022.12.08. 08:30 | 14 |
| 2022.12.08. 08:45 | 14 |
| 2022.12.08. 09:00 | 14 |
| 2022.12.08. 09:15 | 14 |
| 2022.12.08. 09:30 | 14 |
| 2022.12.08. 09:45 | 14 |
| 2022.12.08. 10:00 | 14 |
| 2022.12.08. 10:15 | 14 |
| 2022.12.08. 10:30 | 14 |
| 2022.12.08. 10:45 | 14 |
| 2022.12.08. 11:00 | 14 |
| 2022.12.08. 11:15 | 14 |
| 2022.12.08. 11:30 | 14 |
| 2022.12.08. 11:45 | 14 |
| 2022.12.08. 12:00 | 14 |
| 2022.12.08. 12:15 | 14 |
| 2022.12.08. 12:30 | 14 |
| 2022.12.08. 12:45 | 14 |
| 2022.12.08. 13:00 | 14 |
| 2022.12.08. 13:15 | 14 |
| 2022.12.08. 13:30 | 14 |
| 2022.12.08. 13:45 | 14 |
| 2022.12.08. 14:00 | 14 |
| 2022.12.08. 14:15 | 14 |
| 2022.12.08. 14:30 | 14 |
| 2022.12.08. 14:45 | 14 |
| 2022.12.08. 15:00 | 14 |
| 2022.12.08. 15:15 | 14 |
| 2022.12.08. 15:30 | 14 |
| 2022.12.08. 15:45 | 14 |
| 2022.12.08. 16:00 | 14 |
| 2022.12.08. 16:15 | 14 |
| 2022.12.08. 16:30 | 14 |
| 2022.12.08. 16:45 | 14 |
| 2022.12.08. 17:00 | 14 |
| 2022.12.08. 17:15 | 14 |
| 2022.12.08. 17:30 | 14 |
| 2022.12.08. 17:45 | 14 |
| 2022.12.08. 18:00 | 14 |
| 2022.12.08. 18:15 | 14 |
| 2022.12.08. 18:30 | 14 |
| 2022.12.08. 18:45 | 14 |
| 2022.12.08. 19:00 | 14 |
| 2022.12.08. 19:15 | 14 |
| 2022.12.08. 19:30 | 14 |
| 2022.12.08. 19:45 | 14 |
| 2022.12.08. 20:00 | 14 |
| 2022.12.08. 20:15 | 14 |
| 2022.12.08. 20:30 | 14 |
| 2022.12.08. 20:45 | 14 |
| 2022.12.08. 21:00 | 14 |
| 2022.12.08. 21:15 | 14 |
| 2022.12.08. 21:30 | 14 |
| 2022.12.08. 21:45 | 14 |
| 2022.12.08. 22:00 | 14 |
| 2022.12.08. 22:15 | 14 |
| 2022.12.08. 22:30 | 14 |
| 2022.12.08. 22:45 | 14 |
| 2022.12.08. 23:00 | 14 |
| 2022.12.08. 23:15 | 14 |
| 2022.12.08. 23:30 | 14 |
| 2022.12.08. 23:45 | 14 |
| 2022.12.09. 00:00 | 14 |
| 2022.12.09. 00:15 | 14 |
| 2022.12.09. 00:30 | 14 |
| 2022.12.09. 00:45 | 14 |
| 2022.12.09. 01:00 | 14 |
| 2022.12.09. 01:15 | 14 |
| 2022.12.09. 01:30 | 14 |
| 2022.12.09. 01:45 | 14 |
| 2022.12.09. 02:00 | 14 |
| 2022.12.09. 02:15 | 14 |
| 2022.12.09. 02:30 | 14 |
| 2022.12.09. 02:45 | 14 |
| 2022.12.09. 03:00 | 14 |
| 2022.12.09. 03:15 | 14 |
| 2022.12.09. 03:30 | 14 |
| 2022.12.09. 03:45 | 14 |
| 2022.12.09. 04:00 | 14 |
| 2022.12.09. 04:15 | 14 |
| 2022.12.09. 04:30 | 14 |
| 2022.12.09. 04:45 | 14 |
| 2022.12.09. 05:00 | 14 |
| 2022.12.09. 05:15 | 14 |
| 2022.12.09. 05:30 | 14 |
| 2022.12.09. 05:45 | 14 |
| 2022.12.09. 06:00 | 14 |
| 2022.12.09. 06:15 | 14 |
| 2022.12.09. 06:30 | 14 |
| 2022.12.09. 06:45 | 14 |
| 2022.12.09. 07:00 | 14 |
| 2022.12.09. 07:15 | 14 |
| 2022.12.09. 07:30 | 14 |
| 2022.12.09. 07:45 | 14 |
| 2022.12.09. 08:00 | 14 |
| 2022.12.09. 08:15 | 14 |
| 2022.12.09. 08:30 | 14 |
| 2022.12.09. 08:45 | 14 |
| 2022.12.09. 09:00 | 14 |
| 2022.12.09. 09:15 | 14 |
| 2022.12.09. 09:30 | 14 |
| 2022.12.09. 09:45 | 14 |
| 2022.12.09. 10:00 | 14 |
| 2022.12.09. 10:15 | 14 |
| 2022.12.09. 10:30 | 14 |
| 2022.12.09. 10:45 | 14 |
| 2022.12.09. 11:00 | 14 |
| 2022.12.09. 11:15 | 14 |
| 2022.12.09. 11:30 | 14 |
| 2022.12.09. 11:45 | 14 |
| 2022.12.09. 12:00 | 14 |
| 2022.12.09. 12:15 | 14 |
| 2022.12.09. 12:30 | 14 |
| 2022.12.09. 12:45 | 14 |
| 2022.12.09. 13:00 | 14 |
| 2022.12.09. 13:15 | 14 |
| 2022.12.09. 13:30 | 14 |
| 2022.12.09. 13:45 | 14 |
| 2022.12.09. 14:00 | 14 |
| 2022.12.09. 14:15 | 14 |
| 2022.12.09. 14:30 | 14 |
| 2022.12.09. 14:45 | 14 |
| 2022.12.09. 15:00 | 14 |
| 2022.12.09. 15:15 | 14 |
| 2022.12.09. 15:30 | 14 |
| 2022.12.09. 15:45 | 14 |
| 2022.12.09. 16:00 | 14 |
| 2022.12.09. 16:15 | 14 |
| 2022.12.09. 16:30 | 14 |
| 2022.12.09. 16:45 | 14 |
| 2022.12.09. 17:00 | 14 |
| 2022.12.09. 17:15 | 14 |
| 2022.12.09. 17:30 | 14 |
| 2022.12.09. 17:45 | 14 |
| 2022.12.09. 18:00 | 14 |
| 2022.12.09. 18:15 | 14 |
| 2022.12.09. 18:30 | 14 |
| 2022.12.09. 18:45 | 14 |
| 2022.12.09. 19:00 | 14 |
| 2022.12.09. 19:15 | 14 |
| 2022.12.09. 19:30 | 14 |
| 2022.12.09. 19:45 | 14 |
| 2022.12.09. 20:00 | 14 |
| 2022.12.09. 20:15 | 14 |
| 2022.12.09. 20:30 | 14 |
| 2022.12.09. 20:45 | 14 |
| 2022.12.09. 21:00 | 14 |
| 2022.12.09. 21:15 | 14 |
| 2022.12.09. 21:30 | 14 |
| 2022.12.09. 21:45 | 14 |
| 2022.12.09. 22:00 | 14 |
| 2022.12.09. 22:15 | 14 |
| 2022.12.09. 22:30 | 14 |
| 2022.12.09. 22:45 | 14 |
| 2022.12.09. 23:00 | 14 |
| 2022.12.09. 23:15 | 14 |
| 2022.12.09. 23:30 | 14 |
| 2022.12.09. 23:45 | 14 |
| 2022.12.10. 00:00 | 14 |
| 2022.12.10. 00:15 | 14 |
| 2022.12.10. 00:30 | 14 |
| 2022.12.10. 00:45 | 14 |
| 2022.12.10. 01:00 | 14 |
| 2022.12.10. 01:15 | 14 |
| 2022.12.10. 01:30 | 14 |
| 2022.12.10. 01:45 | 14 |
| 2022.12.10. 02:00 | 14 |
| 2022.12.10. 02:15 | 14 |
| 2022.12.10. 02:30 | 14 |
| 2022.12.10. 02:45 | 14 |
| 2022.12.10. 03:00 | 14 |
| 2022.12.10. 03:15 | 14 |
| 2022.12.10. 03:30 | 14 |
| 2022.12.10. 03:45 | 14 |
| 2022.12.10. 04:00 | 14 |
| 2022.12.10. 04:15 | 14 |
| 2022.12.10. 04:30 | 14 |
| 2022.12.10. 04:45 | 14 |
| 2022.12.10. 05:00 | 14 |
| 2022.12.10. 05:15 | 14 |
| 2022.12.10. 05:30 | 14 |
| 2022.12.10. 05:45 | 14 |
| 2022.12.10. 06:00 | 14 |
| 2022.12.10. 06:15 | 14 |
| 2022.12.10. 06:30 | 14 |
| 2022.12.10. 06:45 | 14 |
| 2022.12.10. 07:00 | 14 |
| 2022.12.10. 07:15 | 14 |
| 2022.12.10. 07:30 | 14 |
| 2022.12.10. 07:45 | 14 |
| 2022.12.10. 08:00 | 14 |
| 2022.12.10. 08:15 | 14 |
| 2022.12.10. 08:30 | 14 |
| 2022.12.10. 08:45 | 14 |
| 2022.12.10. 09:00 | 14 |
| 2022.12.10. 09:15 | 14 |
| 2022.12.10. 09:30 | 14 |
| 2022.12.10. 09:45 | 14 |
| 2022.12.10. 10:00 | 14 |
| 2022.12.10. 10:15 | 14 |
| 2022.12.10. 10:30 | 14 |
| 2022.12.10. 10:45 | 14 |
| 2022.12.10. 11:00 | 14 |
| 2022.12.10. 11:15 | 14 |
| 2022.12.10. 11:30 | 14 |
| 2022.12.10. 11:45 | 14 |
| 2022.12.10. 12:00 | 14 |
| 2022.12.10. 12:15 | 14 |
| 2022.12.10. 12:30 | 14 |
| 2022.12.10. 12:45 | 14 |
| 2022.12.10. 13:00 | 14 |
| 2022.12.10. 13:15 | 14 |
| 2022.12.10. 13:30 | 14 |
| 2022.12.10. 13:45 | 14 |
| 2022.12.10. 14:00 | 14 |
| 2022.12.10. 14:15 | 14 |
| 2022.12.10. 14:30 | 14 |
| 2022.12.10. 14:45 | 14 |
| 2022.12.10. 15:00 | 14 |
| 2022.12.10. 15:15 | 14 |
| 2022.12.10. 15:30 | 14 |
| 2022.12.10. 15:45 | 14 |
| 2022.12.10. 16:00 | 14 |
| 2022.12.10. 16:15 | 14 |
| 2022.12.10. 16:30 | 14 |
| 2022.12.10. 16:45 | 14 |
| 2022.12.10. 17:00 | 14 |
| 2022.12.10. 17:15 | 14 |
| 2022.12.10. 17:30 | 14 |
| 2022.12.10. 17:45 | 14 |
| 2022.12.10. 18:00 | 14 |
| 2022.12.10. 18:15 | 14 |
| 2022.12.10. 18:30 | 14 |
| 2022.12.10. 18:45 | 14 |
| 2022.12.10. 19:00 | 14 |
| 2022.12.10. 19:15 | 14 |
| 2022.12.10. 19:30 | 14 |
| 2022.12.10. 19:45 | 14 |
| 2022.12.10. 20:00 | 14 |
| 2022.12.10. 20:15 | 14 |
| 2022.12.10. 20:30 | 14 |
| 2022.12.10. 20:45 | 14 |
| 2022.12.10. 21:00 | 14 |
| 2022.12.10. 21:15 | 14 |
| 2022.12.10. 21:30 | 14 |
| 2022.12.10. 21:45 | 14 |
| 2022.12.10. 22:00 | 14 |
| 2022.12.10. 22:15 | 14 |
| 2022.12.10. 22:30 | 14 |
| 2022.12.10. 22:45 | 14 |
| 2022.12.10. 23:00 | 14 |
| 2022.12.10. 23:15 | 14 |
| 2022.12.10. 23:30 | 14 |
| 2022.12.10. 23:45 | 14 |
| 2022.12.11. 00:00 | 14 |
| 2022.12.11. 00:15 | 14 |
| 2022.12.11. 00:30 | 14 |
| 2022.12.11. 00:45 | 14 |
| 2022.12.11. 01:00 | 14 |
| 2022.12.11. 01:15 | 14 |
| 2022.12.11. 01:30 | 14 |
| 2022.12.11. 01:45 | 14 |
| 2022.12.11. 02:00 | 14 |
| 2022.12.11. 02:15 | 14 |
| 2022.12.11. 02:30 | 14 |
| 2022.12.11. 02:45 | 14 |
| 2022.12.11. 03:00 | 14 |
| 2022.12.11. 03:15 | 14 |
| 2022.12.11. 03:30 | 14 |
| 2022.12.11. 03:45 | 14 |
| 2022.12.11. 04:00 | 14 |
| 2022.12.11. 04:15 | 14 |
| 2022.12.11. 04:30 | 14 |
| 2022.12.11. 04:45 | 14 |
| 2022.12.11. 05:00 | 14 |
| 2022.12.11. 05:15 | 14 |
| 2022.12.11. 05:30 | 14 |
| 2022.12.11. 05:45 | 14 |
| 2022.12.11. 06:00 | 14 |
| 2022.12.11. 06:15 | 14 |
| 2022.12.11. 06:30 | 14 |
| 2022.12.11. 06:45 | 14 |
| 2022.12.11. 07:00 | 14 |
| 2022.12.11. 07:15 | 14 |
| 2022.12.11. 07:30 | 14 |
| 2022.12.11. 07:45 | 14 |
| 2022.12.11. 08:00 | 14 |
| 2022.12.11. 08:15 | 14 |
| 2022.12.11. 08:30 | 14 |
| 2022.12.11. 08:45 | 14 |
| 2022.12.11. 09:00 | 14 |
| 2022.12.11. 09:15 | 14 |
| 2022.12.11. 09:30 | 14 |
| 2022.12.11. 09:45 | 14 |
| 2022.12.11. 10:00 | 14 |
| 2022.12.11. 10:15 | 14 |
| 2022.12.11. 10:30 | 14 |
| 2022.12.11. 10:45 | 14 |
| 2022.12.11. 11:00 | 14 |
| 2022.12.11. 11:15 | 14 |
| 2022.12.11. 11:30 | 14 |
| 2022.12.11. 11:45 | 14 |
| 2022.12.11. 12:00 | 14 |
| 2022.12.11. 12:15 | 14 |
| 2022.12.11. 12:30 | 14 |
| 2022.12.11. 12:45 | 14 |
| 2022.12.11. 13:00 | 14 |
| 2022.12.11. 13:15 | 14 |
| 2022.12.11. 13:30 | 14 |
| 2022.12.11. 13:45 | 14 |
| 2022.12.11. 14:00 | 14 |
| 2022.12.11. 14:15 | 14 |
| 2022.12.11. 14:30 | 14 |
| 2022.12.11. 14:45 | 14 |
| 2022.12.11. 15:00 | 14 |
| 2022.12.11. 15:15 | 14 |
| 2022.12.11. 15:30 | 14 |
| 2022.12.11. 15:45 | 14 |
| 2022.12.11. 16:00 | 14 |
| 2022.12.11. 16:15 | 14 |
| 2022.12.11. 16:30 | 14 |
| 2022.12.11. 16:45 | 14 |
| 2022.12.11. 17:00 | 14 |
| 2022.12.11. 17:15 | 14 |
| 2022.12.11. 17:30 | 14 |
| 2022.12.11. 17:45 | 14 |
| 2022.12.11. 18:00 | 14 |
| 2022.12.11. 18:15 | 14 |
| 2022.12.11. 18:30 | 14 |
| 2022.12.11. 18:45 | 14 |
| 2022.12.11. 19:00 | 14 |
| 2022.12.11. 19:15 | 14 |
| 2022.12.11. 19:30 | 14 |
| 2022.12.11. 19:45 | 14 |
| 2022.12.11. 20:00 | 14 |
| 2022.12.11. 20:15 | 14 |
| 2022.12.11. 20:30 | 14 |
| 2022.12.11. 20:45 | 14 |
| 2022.12.11. 21:00 | 14 |
| 2022.12.11. 21:15 | 14 |
| 2022.12.11. 21:30 | 14 |
| 2022.12.11. 21:45 | 14 |
| 2022.12.11. 22:00 | 14 |
| 2022.12.11. 22:15 | 14 |
| 2022.12.11. 22:30 | 14 |
| 2022.12.11. 22:45 | 14 |
| 2022.12.11. 23:00 | 14 |
| 2022.12.11. 23:15 | 14 |
| 2022.12.11. 23:30 | 14 |
| 2022.12.11. 23:45 | 14 |
| 2022.12.12. 00:00 | 14 |
| 2022.12.12. 00:15 | 14 |
| 2022.12.12. 00:30 | 14 |
| 2022.12.12. 00:45 | 14 |
| 2022.12.12. 01:00 | 14 |
| 2022.12.12. 01:15 | 14 |
| 2022.12.12. 01:30 | 14 |
| 2022.12.12. 01:45 | 14 |
| 2022.12.12. 02:00 | 14 |
| 2022.12.12. 02:15 | 14 |
| 2022.12.12. 02:30 | 14 |
| 2022.12.12. 02:45 | 14 |
| 2022.12.12. 03:00 | 14 |
| 2022.12.12. 03:15 | 14 |
| 2022.12.12. 03:30 | 14 |
| 2022.12.12. 03:45 | 14 |
| 2022.12.12. 04:00 | 14 |
| 2022.12.12. 04:15 | 14 |
| 2022.12.12. 04:30 | 14 |
| 2022.12.12. 04:45 | 14 |
| 2022.12.12. 05:00 | 14 |
| 2022.12.12. 05:15 | 14 |
| 2022.12.12. 05:30 | 14 |
| 2022.12.12. 05:45 | 14 |
| 2022.12.12. 06:00 | 14 |
| 2022.12.12. 06:15 | 14 |
| 2022.12.12. 06:30 | 14 |
| 2022.12.12. 06:45 | 14 |
| 2022.12.12. 07:00 | 14 |
| 2022.12.12. 07:15 | 14 |
| 2022.12.12. 07:30 | 14 |
| 2022.12.12. 07:45 | 14 |
| 2022.12.12. 08:00 | 14 |
| 2022.12.12. 08:15 | 14 |
| 2022.12.12. 08:30 | 14 |
| 2022.12.12. 08:45 | 14 |
| 2022.12.12. 09:00 | 14 |
| 2022.12.12. 09:15 | 14 |
| 2022.12.12. 09:30 | 14 |
| 2022.12.12. 09:45 | 14 |
| 2022.12.12. 10:00 | 14 |
| 2022.12.12. 10:15 | 14 |
| 2022.12.12. 10:30 | 14 |
| 2022.12.12. 10:45 | 14 |
| 2022.12.12. 11:00 | 14 |
| 2022.12.12. 11:15 | 14 |
| 2022.12.12. 11:30 | 14 |
| 2022.12.12. 11:45 | 14 |
| 2022.12.12. 12:00 | 14 |
| 2022.12.12. 12:15 | 14 |
| 2022.12.12. 12:30 | 14 |
| 2022.12.12. 12:45 | 14 |
| 2022.12.12. 13:00 | 14 |
| 2022.12.12. 13:15 | 14 |
| 2022.12.12. 13:30 | 14 |
| 2022.12.12. 13:45 | 14 |
| 2022.12.12. 14:00 | 14 |
| 2022.12.12. 14:15 | 14 |
| 2022.12.12. 14:30 | 14 |
| 2022.12.12. 14:45 | 14 |
| 2022.12.12. 15:00 | 14 |
| 2022.12.12. 15:15 | 14 |
| 2022.12.12. 15:30 | 14 |
| 2022.12.12. 15:45 | 14 |
| 2022.12.12. 16:00 | 14 |
| 2022.12.12. 16:15 | 14 |
| 2022.12.12. 16:30 | 14 |
| 2022.12.12. 16:45 | 14 |
| 2022.12.12. 17:00 | 14 |
| 2022.12.12. 17:15 | 14 |
| 2022.12.12. 17:30 | 14 |
| 2022.12.12. 17:45 | 14 |
| 2022.12.12. 18:00 | 14 |
| 2022.12.12. 18:15 | 14 |
| 2022.12.12. 18:30 | 14 |
| 2022.12.12. 18:45 | 14 |
| 2022.12.12. 19:00 | 14 |
| 2022.12.12. 19:15 | 14 |
| 2022.12.12. 19:30 | 14 |
| 2022.12.12. 19:45 | 14 |
| 2022.12.12. 20:00 | 14 |
| 2022.12.12. 20:15 | 14 |
| 2022.12.12. 20:30 | 14 |
| 2022.12.12. 20:45 | 14 |
| 2022.12.12. 21:00 | 14 |
| 2022.12.12. 21:15 | 14 |
| 2022.12.12. 21:30 | 14 |
| 2022.12.12. 21:45 | 14 |
| 2022.12.12. 22:00 | 14 |
| 2022.12.12. 22:15 | 14 |
| 2022.12.12. 22:30 | 14 |
| 2022.12.12. 22:45 | 14 |
| 2022.12.12. 23:00 | 14 |
| 2022.12.12. 23:15 | 14 |
| 2022.12.12. 23:30 | 14 |
| 2022.12.12. 23:45 | 14 |
| 2022.12.13. 00:00 | 14 |
| 2022.12.13. 00:15 | 14 |
| 2022.12.13. 00:30 | 14 |
| 2022.12.13. 00:45 | 14 |
| 2022.12.13. 01:00 | 14 |
| 2022.12.13. 01:15 | 14 |
| 2022.12.13. 01:30 | 14 |
| 2022.12.13. 01:45 | 14 |
| 2022.12.13. 02:00 | 14 |
| 2022.12.13. 02:15 | 14 |
| 2022.12.13. 02:30 | 14 |
| 2022.12.13. 02:45 | 14 |
| 2022.12.13. 03:00 | 14 |
| 2022.12.13. 03:15 | 14 |
| 2022.12.13. 03:30 | 14 |
| 2022.12.13. 03:45 | 14 |
| 2022.12.13. 04:00 | 14 |
| 2022.12.13. 04:15 | 14 |
| 2022.12.13. 04:30 | 14 |
| 2022.12.13. 04:45 | 14 |
| 2022.12.13. 05:00 | 14 |
| 2022.12.13. 05:15 | 14 |
| 2022.12.13. 05:30 | 14 |
| 2022.12.13. 05:45 | 14 |
| 2022.12.13. 06:00 | 14 |
| 2022.12.13. 06:15 | 14 |
| 2022.12.13. 06:30 | 14 |
| 2022.12.13. 06:45 | 14 |
| 2022.12.13. 07:00 | 14 |
| 2022.12.13. 07:15 | 14 |
| 2022.12.13. 07:30 | 14 |
| 2022.12.13. 07:45 | 14 |
| 2022.12.13. 08:00 | 14 |
| 2022.12.13. 08:15 | 14 |
| 2022.12.13. 08:30 | 14 |
| 2022.12.13. 08:45 | 14 |
| 2022.12.13. 09:00 | 14 |
| 2022.12.13. 09:15 | 14 |
| 2022.12.13. 09:30 | 14 |
| 2022.12.13. 09:45 | 14 |
| 2022.12.13. 10:00 | 14 |
| 2022.12.13. 10:15 | 14 |
| 2022.12.13. 10:30 | 14 |
| 2022.12.13. 10:45 | 14 |
| 2022.12.13. 11:00 | 14 |
| 2022.12.13. 11:15 | 14 |
| 2022.12.13. 11:30 | 14 |
| 2022.12.13. 11:45 | 14 |
| 2022.12.13. 12:00 | 14 |
| 2022.12.13. 12:15 | 14 |
| 2022.12.13. 12:30 | 14 |
| 2022.12.13. 12:45 | 14 |
| 2022.12.13. 13:00 | 14 |
| 2022.12.13. 13:15 | 14 |
| 2022.12.13. 13:30 | 14 |
| 2022.12.13. 13:45 | 14 |
| 2022.12.13. 14:00 | 14 |
| 2022.12.13. 14:15 | 14 |
| 2022.12.13. 14:30 | 14 |
| 2022.12.13. 14:45 | 14 |
| 2022.12.13. 15:00 | 14 |
| 2022.12.13. 15:15 | 14 |
| 2022.12.13. 15:30 | 14 |
| 2022.12.13. 15:45 | 14 |
| 2022.12.13. 16:00 | 14 |
| 2022.12.13. 16:15 | 14 |
| 2022.12.13. 16:30 | 14 |
| 2022.12.13. 16:45 | 14 |
| 2022.12.13. 17:00 | 14 |
| 2022.12.13. 17:15 | 14 |
| 2022.12.13. 17:30 | 14 |
| 2022.12.13. 17:45 | 14 |
| 2022.12.13. 18:00 | 14 |
| 2022.12.13. 18:15 | 14 |
| 2022.12.13. 18:30 | 14 |
| 2022.12.13. 18:45 | 14 |
| 2022.12.13. 19:00 | 14 |
| 2022.12.13. 19:15 | 14 |
| 2022.12.13. 19:30 | 14 |
| 2022.12.13. 19:45 | 14 |
| 2022.12.13. 20:00 | 14 |
| 2022.12.13. 20:15 | 14 |
| 2022.12.13. 20:30 | 14 |
| 2022.12.13. 20:45 | 14 |
| 2022.12.13. 21:00 | 14 |
| 2022.12.13. 21:15 | 14 |
| 2022.12.13. 21:30 | 14 |
| 2022.12.13. 21:45 | 14 |
| 2022.12.13. 22:00 | 14 |
| 2022.12.13. 22:15 | 14 |
| 2022.12.13. 22:30 | 14 |
| 2022.12.13. 22:45 | 14 |
| 2022.12.13. 23:00 | 14 |
| 2022.12.13. 23:15 | 14 |
| 2022.12.13. 23:30 | 14 |
| 2022.12.13. 23:45 | 14 |
| 2022.12.14. 00:00 | 14 |
| 2022.12.14. 00:15 | 14 |
| 2022.12.14. 00:30 | 14 |
| 2022.12.14. 00:45 | 14 |
| 2022.12.14. 01:00 | 14 |
| 2022.12.14. 01:15 | 14 |
| 2022.12.14. 01:30 | 14 |
| 2022.12.14. 01:45 | 14 |
| 2022.12.14. 02:00 | 14 |
| 2022.12.14. 02:15 | 14 |
| 2022.12.14. 02:30 | 14 |
| 2022.12.14. 02:45 | 14 |
| 2022.12.14. 03:00 | 14 |
| 2022.12.14. 03:15 | 14 |
| 2022.12.14. 03:30 | 14 |
| 2022.12.14. 03:45 | 14 |
| 2022.12.14. 04:00 | 14 |
| 2022.12.14. 04:15 | 14 |
| 2022.12.14. 04:30 | 14 |
| 2022.12.14. 04:45 | 14 |
| 2022.12.14. 05:00 | 14 |
| 2022.12.14. 05:15 | 14 |
| 2022.12.14. 05:30 | 14 |
| 2022.12.14. 05:45 | 14 |
| 2022.12.14. 06:00 | 14 |
| 2022.12.14. 06:15 | 14 |
| 2022.12.14. 06:30 | 14 |
| 2022.12.14. 06:45 | 14 |
| 2022.12.14. 07:00 | 14 |
| 2022.12.14. 07:15 | 14 |
| 2022.12.14. 07:30 | 14 |
| 2022.12.14. 07:45 | 14 |
| 2022.12.14. 08:00 | 14 |
| 2022.12.14. 08:15 | 14 |
| 2022.12.14. 08:30 | 14 |
| 2022.12.14. 08:45 | 14 |
| 2022.12.14. 09:00 | 14 |
| 2022.12.14. 09:15 | 14 |
| 2022.12.14. 09:30 | 14 |
| 2022.12.14. 09:45 | 14 |
| 2022.12.14. 10:00 | 14 |
| 2022.12.14. 10:15 | 14 |
| 2022.12.14. 10:30 | 14 |
| 2022.12.14. 10:45 | 14 |
| 2022.12.14. 11:00 | 14 |
| 2022.12.14. 11:15 | 14 |
| 2022.12.14. 11:30 | 14 |
| 2022.12.14. 11:45 | 14 |
| 2022.12.14. 12:00 | 14 |
| 2022.12.14. 12:15 | 14 |
| 2022.12.14. 12:30 | 14 |
| 2022.12.14. 12:45 | 14 |
| 2022.12.14. 13:00 | 14 |
| 2022.12.14. 13:15 | 14 |
| 2022.12.14. 13:30 | 14 |
| 2022.12.14. 13:45 | 14 |
| 2022.12.14. 14:00 | 14 |
| 2022.12.14. 14:15 | 14 |
| 2022.12.14. 14:30 | 14 |
| 2022.12.14. 14:45 | 14 |
| 2022.12.14. 15:00 | 14 |
| 2022.12.14. 15:15 | 14 |
| 2022.12.14. 15:30 | 14 |
| 2022.12.14. 15:45 | 14 |
| 2022.12.14. 16:00 | 14 |
| 2022.12.14. 16:15 | 14 |
| 2022.12.14. 16:30 | 14 |
| 2022.12.14. 16:45 | 14 |
| 2022.12.14. 17:00 | 14 |
| 2022.12.14. 17:15 | 14 |
| 2022.12.14. 17:30 | 14 |
| 2022.12.14. 17:45 | 14 |
| 2022.12.14. 18:00 | 14 |
| 2022.12.14. 18:15 | 14 |
| 2022.12.14. 18:30 | 14 |
| 2022.12.14. 18:45 | 14 |
| 2022.12.14. 19:00 | 14 |
| 2022.12.14. 19:15 | 14 |
| 2022.12.14. 19:30 | 14 |
| 2022.12.14. 19:45 | 14 |
| 2022.12.14. 20:00 | 14 |
| 2022.12.14. 20:15 | 14 |
| 2022.12.14. 20:30 | 14 |
| 2022.12.14. 20:45 | 14 |
| 2022.12.14. 21:00 | 14 |
| 2022.12.14. 21:15 | 14 |
| 2022.12.14. 21:30 | 14 |
| 2022.12.14. 21:45 | 14 |
| 2022.12.14. 22:00 | 14 |
| 2022.12.14. 22:15 | 14 |
| 2022.12.14. 22:30 | 14 |
| 2022.12.14. 22:45 | 14 |
| 2022.12.14. 23:00 | 14 |
| 2022.12.14. 23:15 | 14 |
| 2022.12.14. 23:30 | 14 |
| 2022.12.14. 23:45 | 14 |
| 2022.12.15. 00:00 | 14 |
| 2022.12.15. 00:15 | 14 |
| 2022.12.15. 00:30 | 14 |
| 2022.12.15. 00:45 | 14 |
| 2022.12.15. 01:00 | 14 |
| 2022.12.15. 01:15 | 14 |
| 2022.12.15. 01:30 | 14 |
| 2022.12.15. 01:45 | 14 |
| 2022.12.15. 02:00 | 14 |
| 2022.12.15. 02:15 | 14 |
| 2022.12.15. 02:30 | 14 |
| 2022.12.15. 02:45 | 14 |
| 2022.12.15. 03:00 | 14 |
| 2022.12.15. 03:15 | 14 |
| 2022.12.15. 03:30 | 14 |
| 2022.12.15. 03:45 | 14 |
| 2022.12.15. 04:00 | 14 |
| 2022.12.15. 04:15 | 14 |
| 2022.12.15. 04:30 | 14 |
| 2022.12.15. 04:45 | 14 |
| 2022.12.15. 05:00 | 14 |
| 2022.12.15. 05:15 | 14 |
| 2022.12.15. 05:30 | 14 |
| 2022.12.15. 05:45 | 14 |
| 2022.12.15. 06:00 | 14 |
| 2022.12.15. 06:15 | 14 |
| 2022.12.15. 06:30 | 14 |
| 2022.12.15. 06:45 | 14 |
| 2022.12.15. 07:00 | 14 |
| 2022.12.15. 07:15 | 14 |
| 2022.12.15. 07:30 | 14 |
| 2022.12.15. 07:45 | 14 |
| 2022.12.15. 08:00 | 14 |
| 2022.12.15. 08:15 | 14 |
| 2022.12.15. 08:30 | 14 |
| 2022.12.15. 08:45 | 14 |
| 2022.12.15. 09:00 | 14 |
| 2022.12.15. 09:15 | 14 |
| 2022.12.15. 09:30 | 14 |
| 2022.12.15. 09:45 | 14 |
| 2022.12.15. 10:00 | 14 |
| 2022.12.15. 10:15 | 14 |
| 2022.12.15. 10:30 | 14 |
| 2022.12.15. 10:45 | 14 |
| 2022.12.15. 11:00 | 14 |
| 2022.12.15. 11:15 | 14 |
| 2022.12.15. 11:30 | 14 |
| 2022.12.15. 11:45 | 14 |
| 2022.12.15. 12:00 | 14 |
| 2022.12.15. 12:15 | 14 |
| 2022.12.15. 12:30 | 14 |
| 2022.12.15. 12:45 | 14 |
| 2022.12.15. 13:00 | 14 |
| 2022.12.15. 13:15 | 14 |
| 2022.12.15. 13:30 | 14 |
| 2022.12.15. 13:45 | 14 |
| 2022.12.15. 14:00 | 14 |
| 2022.12.15. 14:15 | 14 |
| 2022.12.15. 14:30 | 14 |
| 2022.12.15. 14:45 | 14 |
| 2022.12.15. 15:00 | 14 |
| 2022.12.15. 15:15 | 14 |
| 2022.12.15. 15:30 | 14 |
| 2022.12.15. 15:45 | 14 |
| 2022.12.15. 16:00 | 14 |
| 2022.12.15. 16:15 | 14 |
| 2022.12.15. 16:30 | 14 |
| 2022.12.15. 16:45 | 14 |
| 2022.12.15. 17:00 | 14 |
| 2022.12.15. 17:15 | 14 |
| 2022.12.15. 17:30 | 14 |
| 2022.12.15. 17:45 | 14 |
| 2022.12.15. 18:00 | 14 |
| 2022.12.15. 18:15 | 14 |
| 2022.12.15. 18:30 | 14 |
| 2022.12.15. 18:45 | 14 |
| 2022.12.15. 19:00 | 14 |
| 2022.12.15. 19:15 | 14 |
| 2022.12.15. 19:30 | 14 |
| 2022.12.15. 19:45 | 14 |
| 2022.12.15. 20:00 | 14 |
| 2022.12.15. 20:15 | 14 |
| 2022.12.15. 20:30 | 14 |
| 2022.12.15. 20:45 | 14 |
| 2022.12.15. 21:00 | 14 |
| 2022.12.15. 21:15 | 14 |
| 2022.12.15. 21:30 | 14 |
| 2022.12.15. 21:45 | 14 |
| 2022.12.15. 22:00 | 14 |
| 2022.12.15. 22:15 | 14 |
| 2022.12.15. 22:30 | 14 |
| 2022.12.15. 22:45 | 14 |
| 2022.12.15. 23:00 | 14 |
| 2022.12.15. 23:15 | 14 |
| 2022.12.15. 23:30 | 14 |
| 2022.12.15. 23:45 | 14 |
| 2022.12.16. 00:00 | 13 |
| 2022.12.16. 00:15 | 13 |
| 2022.12.16. 00:30 | 13 |
| 2022.12.16. 00:45 | 13 |
| 2022.12.16. 01:00 | 13 |
| 2022.12.16. 01:15 | 13 |
| 2022.12.16. 01:30 | 13 |
| 2022.12.16. 01:45 | 13 |
| 2022.12.16. 02:00 | 13 |
| 2022.12.16. 02:15 | 13 |
| 2022.12.16. 02:30 | 13 |
| 2022.12.16. 02:45 | 13 |
| 2022.12.16. 03:00 | 13 |
| 2022.12.16. 03:15 | 13 |
| 2022.12.16. 03:30 | 13 |
| 2022.12.16. 03:45 | 13 |
| 2022.12.16. 04:00 | 13 |
| 2022.12.16. 04:15 | 13 |
| 2022.12.16. 04:30 | 13 |
| 2022.12.16. 04:45 | 13 |
| 2022.12.16. 05:00 | 13 |
| 2022.12.16. 05:15 | 13 |
| 2022.12.16. 05:30 | 13 |
| 2022.12.16. 05:45 | 13 |
| 2022.12.16. 06:00 | 13 |
| 2022.12.16. 06:15 | 13 |
| 2022.12.16. 06:30 | 13 |
| 2022.12.16. 06:45 | 13 |
| 2022.12.16. 07:00 | 13 |
| 2022.12.16. 07:15 | 13 |
| 2022.12.16. 07:30 | 13 |
| 2022.12.16. 07:45 | 13 |
| 2022.12.16. 08:00 | 13 |
| 2022.12.16. 08:15 | 13 |
| 2022.12.16. 08:30 | 13 |
| 2022.12.16. 08:45 | 13 |
| 2022.12.16. 09:00 | 13 |
| 2022.12.16. 09:15 | 13 |
| 2022.12.16. 09:30 | 13 |
| 2022.12.16. 09:45 | 13 |
| 2022.12.16. 10:00 | 13 |
| 2022.12.16. 10:15 | 13 |
| 2022.12.16. 10:30 | 13 |
| 2022.12.16. 10:45 | 13 |
| 2022.12.16. 11:00 | 13 |
| 2022.12.16. 11:15 | 13 |
| 2022.12.16. 11:30 | 13 |
| 2022.12.16. 11:45 | 13 |
| 2022.12.16. 12:00 | 13 |
| 2022.12.16. 12:15 | 13 |
| 2022.12.16. 12:30 | 13 |
| 2022.12.16. 12:45 | 13 |
| 2022.12.16. 13:00 | 13 |
| 2022.12.16. 13:15 | 13 |
| 2022.12.16. 13:30 | 13 |
| 2022.12.16. 13:45 | 13 |
| 2022.12.16. 14:00 | 13 |
| 2022.12.16. 14:15 | 13 |
| 2022.12.16. 14:30 | 13 |
| 2022.12.16. 14:45 | 13 |
| 2022.12.16. 15:00 | 13 |
| 2022.12.16. 15:15 | 13 |
| 2022.12.16. 15:30 | 13 |
| 2022.12.16. 15:45 | 13 |
| 2022.12.16. 16:00 | 13 |
| 2022.12.16. 16:15 | 13 |
| 2022.12.16. 16:30 | 13 |
| 2022.12.16. 16:45 | 13 |
| 2022.12.16. 17:00 | 13 |
| 2022.12.16. 17:15 | 13 |
| 2022.12.16. 17:30 | 13 |
| 2022.12.16. 17:45 | 13 |
| 2022.12.16. 18:00 | 13 |
| 2022.12.16. 18:15 | 13 |
| 2022.12.16. 18:30 | 13 |
| 2022.12.16. 18:45 | 13 |
| 2022.12.16. 19:00 | 13 |
| 2022.12.16. 19:15 | 13 |
| 2022.12.16. 19:30 | 13 |
| 2022.12.16. 19:45 | 13 |
| 2022.12.16. 20:00 | 13 |
| 2022.12.16. 20:15 | 13 |
| 2022.12.16. 20:30 | 13 |
| 2022.12.16. 20:45 | 13 |
| 2022.12.16. 21:00 | 13 |
| 2022.12.16. 21:15 | 13 |
| 2022.12.16. 21:30 | 13 |
| 2022.12.16. 21:45 | 13 |
| 2022.12.16. 22:00 | 13 |
| 2022.12.16. 22:15 | 13 |
| 2022.12.16. 22:30 | 13 |
| 2022.12.16. 22:45 | 13 |
| 2022.12.16. 23:00 | 13 |
| 2022.12.16. 23:15 | 13 |
| 2022.12.16. 23:30 | 13 |
| 2022.12.16. 23:45 | 13 |
| 2022.12.17. 00:00 | 13 |
| 2022.12.17. 00:15 | 13 |
| 2022.12.17. 00:30 | 13 |
| 2022.12.17. 00:45 | 13 |
| 2022.12.17. 01:00 | 13 |
| 2022.12.17. 01:15 | 13 |
| 2022.12.17. 01:30 | 13 |
| 2022.12.17. 01:45 | 13 |
| 2022.12.17. 02:00 | 13 |
| 2022.12.17. 02:15 | 13 |
| 2022.12.17. 02:30 | 13 |
| 2022.12.17. 02:45 | 13 |
| 2022.12.17. 03:00 | 13 |
| 2022.12.17. 03:15 | 13 |
| 2022.12.17. 03:30 | 13 |
| 2022.12.17. 03:45 | 13 |
| 2022.12.17. 04:00 | 13 |
| 2022.12.17. 04:15 | 13 |
| 2022.12.17. 04:30 | 13 |
| 2022.12.17. 04:45 | 13 |
| 2022.12.17. 05:00 | 13 |
| 2022.12.17. 05:15 | 13 |
| 2022.12.17. 05:30 | 13 |
| 2022.12.17. 05:45 | 13 |
| 2022.12.17. 06:00 | 13 |
| 2022.12.17. 06:15 | 13 |
| 2022.12.17. 06:30 | 13 |
| 2022.12.17. 06:45 | 13 |
| 2022.12.17. 07:00 | 13 |
| 2022.12.17. 07:15 | 13 |
| 2022.12.17. 07:30 | 13 |
| 2022.12.17. 07:45 | 13 |
| 2022.12.17. 08:00 | 13 |
| 2022.12.17. 08:15 | 13 |
| 2022.12.17. 08:30 | 13 |
| 2022.12.17. 08:45 | 13 |
| 2022.12.17. 09:00 | 13 |
| 2022.12.17. 09:15 | 13 |
| 2022.12.17. 09:30 | 13 |
| 2022.12.17. 09:45 | 13 |
| 2022.12.17. 10:00 | 13 |
| 2022.12.17. 10:15 | 13 |
| 2022.12.17. 10:30 | 13 |
| 2022.12.17. 10:45 | 13 |
| 2022.12.17. 11:00 | 13 |
| 2022.12.17. 11:15 | 13 |
| 2022.12.17. 11:30 | 13 |
| 2022.12.17. 11:45 | 13 |
| 2022.12.17. 12:00 | 13 |
| 2022.12.17. 12:15 | 13 |
| 2022.12.17. 12:30 | 13 |
| 2022.12.17. 12:45 | 13 |
| 2022.12.17. 13:00 | 13 |
| 2022.12.17. 13:15 | 13 |
| 2022.12.17. 13:30 | 13 |
| 2022.12.17. 13:45 | 13 |
| 2022.12.17. 14:00 | 13 |
| 2022.12.17. 14:15 | 13 |
| 2022.12.17. 14:30 | 13 |
| 2022.12.17. 14:45 | 13 |
| 2022.12.17. 15:00 | 13 |
| 2022.12.17. 15:15 | 13 |
| 2022.12.17. 15:30 | 13 |
| 2022.12.17. 15:45 | 13 |
| 2022.12.17. 16:00 | 13 |
| 2022.12.17. 16:15 | 13 |
| 2022.12.17. 16:30 | 13 |
| 2022.12.17. 16:45 | 13 |
| 2022.12.17. 17:00 | 13 |
| 2022.12.17. 17:15 | 13 |
| 2022.12.17. 17:30 | 13 |
| 2022.12.17. 17:45 | 13 |
| 2022.12.17. 18:00 | 13 |
| 2022.12.17. 18:15 | 13 |
| 2022.12.17. 18:30 | 13 |
| 2022.12.17. 18:45 | 13 |
| 2022.12.17. 19:00 | 13 |
| 2022.12.17. 19:15 | 13 |
| 2022.12.17. 19:30 | 13 |
| 2022.12.17. 19:45 | 13 |
| 2022.12.17. 20:00 | 13 |
| 2022.12.17. 20:15 | 13 |
| 2022.12.17. 20:30 | 13 |
| 2022.12.17. 20:45 | 13 |
| 2022.12.17. 21:00 | 13 |
| 2022.12.17. 21:15 | 13 |
| 2022.12.17. 21:30 | 13 |
| 2022.12.17. 21:45 | 13 |
| 2022.12.17. 22:00 | 13 |
| 2022.12.17. 22:15 | 13 |
| 2022.12.17. 22:30 | 13 |
| 2022.12.17. 22:45 | 13 |
| 2022.12.17. 23:00 | 13 |
| 2022.12.17. 23:15 | 13 |
| 2022.12.17. 23:30 | 13 |
| 2022.12.17. 23:45 | 13 |
| 2022.12.18. 00:00 | 13 |
| 2022.12.18. 00:15 | 13 |
| 2022.12.18. 00:30 | 13 |
| 2022.12.18. 00:45 | 13 |
| 2022.12.18. 01:00 | 13 |
| 2022.12.18. 01:15 | 13 |
| 2022.12.18. 01:30 | 13 |
| 2022.12.18. 01:45 | 13 |
| 2022.12.18. 02:00 | 13 |
| 2022.12.18. 02:15 | 13 |
| 2022.12.18. 02:30 | 13 |
| 2022.12.18. 02:45 | 13 |
| 2022.12.18. 03:00 | 13 |
| 2022.12.18. 03:15 | 13 |
| 2022.12.18. 03:30 | 13 |
| 2022.12.18. 03:45 | 13 |
| 2022.12.18. 04:00 | 13 |
| 2022.12.18. 04:15 | 13 |
| 2022.12.18. 04:30 | 13 |
| 2022.12.18. 04:45 | 13 |
| 2022.12.18. 05:00 | 13 |
| 2022.12.18. 05:15 | 13 |
| 2022.12.18. 05:30 | 13 |
| 2022.12.18. 05:45 | 13 |
| 2022.12.18. 06:00 | 13 |
| 2022.12.18. 06:15 | 13 |
| 2022.12.18. 06:30 | 13 |
| 2022.12.18. 06:45 | 13 |
| 2022.12.18. 07:00 | 13 |
| 2022.12.18. 07:15 | 13 |
| 2022.12.18. 07:30 | 13 |
| 2022.12.18. 07:45 | 13 |
| 2022.12.18. 08:00 | 13 |
| 2022.12.18. 08:15 | 13 |
| 2022.12.18. 08:30 | 13 |
| 2022.12.18. 08:45 | 13 |
| 2022.12.18. 09:00 | 13 |
| 2022.12.18. 09:15 | 13 |
| 2022.12.18. 09:30 | 13 |
| 2022.12.18. 09:45 | 13 |
| 2022.12.18. 10:00 | 13 |
| 2022.12.18. 10:15 | 13 |
| 2022.12.18. 10:30 | 13 |
| 2022.12.18. 10:45 | 13 |
| 2022.12.18. 11:00 | 13 |
| 2022.12.18. 11:15 | 13 |
| 2022.12.18. 11:30 | 13 |
| 2022.12.18. 11:45 | 13 |
| 2022.12.18. 12:00 | 13 |
| 2022.12.18. 12:15 | 13 |
| 2022.12.18. 12:30 | 13 |
| 2022.12.18. 12:45 | 13 |
| 2022.12.18. 13:00 | 13 |
| 2022.12.18. 13:15 | 13 |
| 2022.12.18. 13:30 | 13 |
| 2022.12.18. 13:45 | 13 |
| 2022.12.18. 14:00 | 13 |
| 2022.12.18. 14:15 | 13 |
| 2022.12.18. 14:30 | 13 |
| 2022.12.18. 14:45 | 13 |
| 2022.12.18. 15:00 | 13 |
| 2022.12.18. 15:15 | 13 |
| 2022.12.18. 15:30 | 13 |
| 2022.12.18. 15:45 | 13 |
| 2022.12.18. 16:00 | 13 |
| 2022.12.18. 16:15 | 13 |
| 2022.12.18. 16:30 | 13 |
| 2022.12.18. 16:45 | 13 |
| 2022.12.18. 17:00 | 13 |
| 2022.12.18. 17:15 | 13 |
| 2022.12.18. 17:30 | 13 |
| 2022.12.18. 17:45 | 13 |
| 2022.12.18. 18:00 | 13 |
| 2022.12.18. 18:15 | 13 |
| 2022.12.18. 18:30 | 13 |
| 2022.12.18. 18:45 | 13 |
| 2022.12.18. 19:00 | 13 |
| 2022.12.18. 19:15 | 13 |
| 2022.12.18. 19:30 | 13 |
| 2022.12.18. 19:45 | 13 |
| 2022.12.18. 20:00 | 13 |
| 2022.12.18. 20:15 | 13 |
| 2022.12.18. 20:30 | 13 |
| 2022.12.18. 20:45 | 13 |
| 2022.12.18. 21:00 | 13 |
| 2022.12.18. 21:15 | 13 |
| 2022.12.18. 21:30 | 13 |
| 2022.12.18. 21:45 | 13 |
| 2022.12.18. 22:00 | 13 |
| 2022.12.18. 22:15 | 13 |
| 2022.12.18. 22:30 | 13 |
| 2022.12.18. 22:45 | 13 |
| 2022.12.18. 23:00 | 13 |
| 2022.12.18. 23:15 | 13 |
| 2022.12.18. 23:30 | 13 |
| 2022.12.18. 23:45 | 13 |
| 2022.12.19. 00:00 | 13 |
| 2022.12.19. 00:15 | 13 |
| 2022.12.19. 00:30 | 13 |
| 2022.12.19. 00:45 | 13 |
| 2022.12.19. 01:00 | 13 |
| 2022.12.19. 01:15 | 13 |
| 2022.12.19. 01:30 | 13 |
| 2022.12.19. 01:45 | 13 |
| 2022.12.19. 02:00 | 13 |
| 2022.12.19. 02:15 | 13 |
| 2022.12.19. 02:30 | 13 |
| 2022.12.19. 02:45 | 13 |
| 2022.12.19. 03:00 | 13 |
| 2022.12.19. 03:15 | 13 |
| 2022.12.19. 03:30 | 13 |
| 2022.12.19. 03:45 | 13 |
| 2022.12.19. 04:00 | 13 |
| 2022.12.19. 04:15 | 13 |
| 2022.12.19. 04:30 | 13 |
| 2022.12.19. 04:45 | 13 |
| 2022.12.19. 05:00 | 13 |
| 2022.12.19. 05:15 | 13 |
| 2022.12.19. 05:30 | 13 |
| 2022.12.19. 05:45 | 13 |
| 2022.12.19. 06:00 | 13 |
| 2022.12.19. 06:15 | 13 |
| 2022.12.19. 06:30 | 13 |
| 2022.12.19. 06:45 | 13 |
| 2022.12.19. 07:00 | 13 |
| 2022.12.19. 07:15 | 13 |
| 2022.12.19. 07:30 | 13 |
| 2022.12.19. 07:45 | 13 |
| 2022.12.19. 08:00 | 13 |
| 2022.12.19. 08:15 | 13 |
| 2022.12.19. 08:30 | 13 |
| 2022.12.19. 08:45 | 13 |
| 2022.12.19. 09:00 | 13 |
| 2022.12.19. 09:15 | 13 |
| 2022.12.19. 09:30 | 13 |
| 2022.12.19. 09:45 | 13 |
| 2022.12.19. 10:00 | 13 |
| 2022.12.19. 10:15 | 13 |
| 2022.12.19. 10:30 | 13 |
| 2022.12.19. 10:45 | 13 |
| 2022.12.19. 11:00 | 13 |
| 2022.12.19. 11:15 | 13 |
| 2022.12.19. 11:30 | 13 |
| 2022.12.19. 11:45 | 13 |
| 2022.12.19. 12:00 | 13 |
| 2022.12.19. 12:15 | 13 |
| 2022.12.19. 12:30 | 13 |
| 2022.12.19. 12:45 | 13 |
| 2022.12.19. 13:00 | 13 |
| 2022.12.19. 13:15 | 13 |
| 2022.12.19. 13:30 | 13 |
| 2022.12.19. 13:45 | 13 |
| 2022.12.19. 14:00 | 13 |
| 2022.12.19. 14:15 | 13 |
| 2022.12.19. 14:30 | 13 |
| 2022.12.19. 14:45 | 13 |
| 2022.12.19. 15:00 | 13 |
| 2022.12.19. 15:15 | 13 |
| 2022.12.19. 15:30 | 13 |
| 2022.12.19. 15:45 | 13 |
| 2022.12.19. 16:00 | 13 |
| 2022.12.19. 16:15 | 13 |
| 2022.12.19. 16:30 | 13 |
| 2022.12.19. 16:45 | 13 |
| 2022.12.19. 17:00 | 13 |
| 2022.12.19. 17:15 | 13 |
| 2022.12.19. 17:30 | 13 |
| 2022.12.19. 17:45 | 13 |
| 2022.12.19. 18:00 | 13 |
| 2022.12.19. 18:15 | 13 |
| 2022.12.19. 18:30 | 13 |
| 2022.12.19. 18:45 | 13 |
| 2022.12.19. 19:00 | 13 |
| 2022.12.19. 19:15 | 13 |
| 2022.12.19. 19:30 | 13 |
| 2022.12.19. 19:45 | 13 |
| 2022.12.19. 20:00 | 13 |
| 2022.12.19. 20:15 | 13 |
| 2022.12.19. 20:30 | 13 |
| 2022.12.19. 20:45 | 13 |
| 2022.12.19. 21:00 | 13 |
| 2022.12.19. 21:15 | 13 |
| 2022.12.19. 21:30 | 13 |
| 2022.12.19. 21:45 | 13 |
| 2022.12.19. 22:00 | 13 |
| 2022.12.19. 22:15 | 13 |
| 2022.12.19. 22:30 | 13 |
| 2022.12.19. 22:45 | 13 |
| 2022.12.19. 23:00 | 13 |
| 2022.12.19. 23:15 | 13 |
| 2022.12.19. 23:30 | 13 |
| 2022.12.19. 23:45 | 13 |
| 2022.12.20. 00:00 | 13 |
| 2022.12.20. 00:15 | 13 |
| 2022.12.20. 00:30 | 13 |
| 2022.12.20. 00:45 | 13 |
| 2022.12.20. 01:00 | 13 |
| 2022.12.20. 01:15 | 13 |
| 2022.12.20. 01:30 | 13 |
| 2022.12.20. 01:45 | 13 |
| 2022.12.20. 02:00 | 13 |
| 2022.12.20. 02:15 | 13 |
| 2022.12.20. 02:30 | 13 |
| 2022.12.20. 02:45 | 13 |
| 2022.12.20. 03:00 | 13 |
| 2022.12.20. 03:15 | 13 |
| 2022.12.20. 03:30 | 13 |
| 2022.12.20. 03:45 | 13 |
| 2022.12.20. 04:00 | 13 |
| 2022.12.20. 04:15 | 13 |
| 2022.12.20. 04:30 | 13 |
| 2022.12.20. 04:45 | 13 |
| 2022.12.20. 05:00 | 13 |
| 2022.12.20. 05:15 | 13 |
| 2022.12.20. 05:30 | 13 |
| 2022.12.20. 05:45 | 13 |
| 2022.12.20. 06:00 | 13 |
| 2022.12.20. 06:15 | 13 |
| 2022.12.20. 06:30 | 13 |
| 2022.12.20. 06:45 | 13 |
| 2022.12.20. 07:00 | 13 |
| 2022.12.20. 07:15 | 13 |
| 2022.12.20. 07:30 | 13 |
| 2022.12.20. 07:45 | 13 |
| 2022.12.20. 08:00 | 13 |
| 2022.12.20. 08:15 | 13 |
| 2022.12.20. 08:30 | 13 |
| 2022.12.20. 08:45 | 13 |
| 2022.12.20. 09:00 | 13 |
| 2022.12.20. 09:15 | 13 |
| 2022.12.20. 09:30 | 13 |
| 2022.12.20. 09:45 | 13 |
| 2022.12.20. 10:00 | 13 |
| 2022.12.20. 10:15 | 13 |
| 2022.12.20. 10:30 | 13 |
| 2022.12.20. 10:45 | 13 |
| 2022.12.20. 11:00 | 13 |
| 2022.12.20. 11:15 | 13 |
| 2022.12.20. 11:30 | 13 |
| 2022.12.20. 11:45 | 13 |
| 2022.12.20. 12:00 | 13 |
| 2022.12.20. 12:15 | 13 |
| 2022.12.20. 12:30 | 13 |
| 2022.12.20. 12:45 | 13 |
| 2022.12.20. 13:00 | 13 |
| 2022.12.20. 13:15 | 13 |
| 2022.12.20. 13:30 | 13 |
| 2022.12.20. 13:45 | 13 |
| 2022.12.20. 14:00 | 13 |
| 2022.12.20. 14:15 | 13 |
| 2022.12.20. 14:30 | 13 |
| 2022.12.20. 14:45 | 13 |
| 2022.12.20. 15:00 | 13 |
| 2022.12.20. 15:15 | 13 |
| 2022.12.20. 15:30 | 13 |
| 2022.12.20. 15:45 | 13 |
| 2022.12.20. 16:00 | 13 |
| 2022.12.20. 16:15 | 13 |
| 2022.12.20. 16:30 | 13 |
| 2022.12.20. 16:45 | 13 |
| 2022.12.20. 17:00 | 13 |
| 2022.12.20. 17:15 | 13 |
| 2022.12.20. 17:30 | 13 |
| 2022.12.20. 17:45 | 13 |
| 2022.12.20. 18:00 | 13 |
| 2022.12.20. 18:15 | 13 |
| 2022.12.20. 18:30 | 13 |
| 2022.12.20. 18:45 | 13 |
| 2022.12.20. 19:00 | 13 |
| 2022.12.20. 19:15 | 13 |
| 2022.12.20. 19:30 | 13 |
| 2022.12.20. 19:45 | 13 |
| 2022.12.20. 20:00 | 13 |
| 2022.12.20. 20:15 | 13 |
| 2022.12.20. 20:30 | 13 |
| 2022.12.20. 20:45 | 13 |
| 2022.12.20. 21:00 | 13 |
| 2022.12.20. 21:15 | 13 |
| 2022.12.20. 21:30 | 13 |
| 2022.12.20. 21:45 | 13 |
| 2022.12.20. 22:00 | 13 |
| 2022.12.20. 22:15 | 13 |
| 2022.12.20. 22:30 | 13 |
| 2022.12.20. 22:45 | 13 |
| 2022.12.20. 23:00 | 13 |
| 2022.12.20. 23:15 | 13 |
| 2022.12.20. 23:30 | 13 |
| 2022.12.20. 23:45 | 13 |
| 2022.12.21. 00:00 | 13 |
| 2022.12.21. 00:15 | 13 |
| 2022.12.21. 00:30 | 13 |
| 2022.12.21. 00:45 | 13 |
| 2022.12.21. 01:00 | 13 |
| 2022.12.21. 01:15 | 13 |
| 2022.12.21. 01:30 | 13 |
| 2022.12.21. 01:45 | 13 |
| 2022.12.21. 02:00 | 13 |
| 2022.12.21. 02:15 | 13 |
| 2022.12.21. 02:30 | 13 |
| 2022.12.21. 02:45 | 13 |
| 2022.12.21. 03:00 | 13 |
| 2022.12.21. 03:15 | 13 |
| 2022.12.21. 03:30 | 13 |
| 2022.12.21. 03:45 | 13 |
| 2022.12.21. 04:00 | 13 |
| 2022.12.21. 04:15 | 13 |
| 2022.12.21. 04:30 | 13 |
| 2022.12.21. 04:45 | 13 |
| 2022.12.21. 05:00 | 13 |
| 2022.12.21. 05:15 | 13 |
| 2022.12.21. 05:30 | 13 |
| 2022.12.21. 05:45 | 13 |
| 2022.12.21. 06:00 | 13 |
| 2022.12.21. 06:15 | 13 |
| 2022.12.21. 06:30 | 13 |
| 2022.12.21. 06:45 | 13 |
| 2022.12.21. 07:00 | 13 |
| 2022.12.21. 07:15 | 13 |
| 2022.12.21. 07:30 | 13 |
| 2022.12.21. 07:45 | 13 |
| 2022.12.21. 08:00 | 13 |
| 2022.12.21. 08:15 | 13 |
| 2022.12.21. 08:30 | 13 |
| 2022.12.21. 08:45 | 13 |
| 2022.12.21. 09:00 | 13 |
| 2022.12.21. 09:15 | 13 |
| 2022.12.21. 09:30 | 13 |
| 2022.12.21. 09:45 | 13 |
| 2022.12.21. 10:00 | 13 |
| 2022.12.21. 10:15 | 13 |
| 2022.12.21. 10:30 | 13 |
| 2022.12.21. 10:45 | 13 |
| 2022.12.21. 11:00 | 13 |
| 2022.12.21. 11:15 | 13 |
| 2022.12.21. 11:30 | 13 |
| 2022.12.21. 11:45 | 13 |
| 2022.12.21. 12:00 | 13 |
| 2022.12.21. 12:15 | 13 |
| 2022.12.21. 12:30 | 13 |
| 2022.12.21. 12:45 | 13 |
| 2022.12.21. 13:00 | 13 |
| 2022.12.21. 13:15 | 13 |
| 2022.12.21. 13:30 | 13 |
| 2022.12.21. 13:45 | 13 |
| 2022.12.21. 14:00 | 13 |
| 2022.12.21. 14:15 | 13 |
| 2022.12.21. 14:30 | 13 |
| 2022.12.21. 14:45 | 13 |
| 2022.12.21. 15:00 | 13 |
| 2022.12.21. 15:15 | 13 |
| 2022.12.21. 15:30 | 13 |
| 2022.12.21. 15:45 | 13 |
| 2022.12.21. 16:00 | 13 |
| 2022.12.21. 16:15 | 13 |
| 2022.12.21. 16:30 | 13 |
| 2022.12.21. 16:45 | 13 |
| 2022.12.21. 17:00 | 13 |
| 2022.12.21. 17:15 | 13 |
| 2022.12.21. 17:30 | 13 |
| 2022.12.21. 17:45 | 13 |
| 2022.12.21. 18:00 | 13 |
| 2022.12.21. 18:15 | 13 |
| 2022.12.21. 18:30 | 13 |
| 2022.12.21. 18:45 | 13 |
| 2022.12.21. 19:00 | 13 |
| 2022.12.21. 19:15 | 13 |
| 2022.12.21. 19:30 | 13 |
| 2022.12.21. 19:45 | 13 |
| 2022.12.21. 20:00 | 13 |
| 2022.12.21. 20:15 | 13 |
| 2022.12.21. 20:30 | 13 |
| 2022.12.21. 20:45 | 13 |
| 2022.12.21. 21:00 | 13 |
| 2022.12.21. 21:15 | 13 |
| 2022.12.21. 21:30 | 13 |
| 2022.12.21. 21:45 | 13 |
| 2022.12.21. 22:00 | 13 |
| 2022.12.21. 22:15 | 13 |
| 2022.12.21. 22:30 | 13 |
| 2022.12.21. 22:45 | 13 |
| 2022.12.21. 23:00 | 13 |
| 2022.12.21. 23:15 | 13 |
| 2022.12.21. 23:30 | 13 |
| 2022.12.21. 23:45 | 13 |
| 2022.12.22. 00:00 | 13 |
| 2022.12.22. 00:15 | 13 |
| 2022.12.22. 00:30 | 13 |
| 2022.12.22. 00:45 | 13 |
| 2022.12.22. 01:00 | 13 |
| 2022.12.22. 01:15 | 13 |
| 2022.12.22. 01:30 | 13 |
| 2022.12.22. 01:45 | 13 |
| 2022.12.22. 02:00 | 13 |
| 2022.12.22. 02:15 | 13 |
| 2022.12.22. 02:30 | 13 |
| 2022.12.22. 02:45 | 13 |
| 2022.12.22. 03:00 | 13 |
| 2022.12.22. 03:15 | 13 |
| 2022.12.22. 03:30 | 13 |
| 2022.12.22. 03:45 | 13 |
| 2022.12.22. 04:00 | 13 |
| 2022.12.22. 04:15 | 13 |
| 2022.12.22. 04:30 | 13 |
| 2022.12.22. 04:45 | 13 |
| 2022.12.22. 05:00 | 13 |
| 2022.12.22. 05:15 | 13 |
| 2022.12.22. 05:30 | 13 |
| 2022.12.22. 05:45 | 13 |
| 2022.12.22. 06:00 | 13 |
| 2022.12.22. 06:15 | 13 |
| 2022.12.22. 06:30 | 13 |
| 2022.12.22. 06:45 | 13 |
| 2022.12.22. 07:00 | 13 |
| 2022.12.22. 07:15 | 13 |
| 2022.12.22. 07:30 | 13 |
| 2022.12.22. 07:45 | 13 |
| 2022.12.22. 08:00 | 13 |
| 2022.12.22. 08:15 | 13 |
| 2022.12.22. 08:30 | 13 |
| 2022.12.22. 08:45 | 13 |
| 2022.12.22. 09:00 | 13 |
| 2022.12.22. 09:15 | 13 |
| 2022.12.22. 09:30 | 13 |
| 2022.12.22. 09:45 | 13 |
| 2022.12.22. 10:00 | 13 |
| 2022.12.22. 10:15 | 13 |
| 2022.12.22. 10:30 | 13 |
| 2022.12.22. 10:45 | 13 |
| 2022.12.22. 11:00 | 13 |
| 2022.12.22. 11:15 | 13 |
| 2022.12.22. 11:30 | 13 |
| 2022.12.22. 11:45 | 13 |
| 2022.12.22. 12:00 | 13 |
| 2022.12.22. 12:15 | 13 |
| 2022.12.22. 12:30 | 13 |
| 2022.12.22. 12:45 | 13 |
| 2022.12.22. 13:00 | 13 |
| 2022.12.22. 13:15 | 13 |
| 2022.12.22. 13:30 | 13 |
| 2022.12.22. 13:45 | 13 |
| 2022.12.22. 14:00 | 13 |
| 2022.12.22. 14:15 | 13 |
| 2022.12.22. 14:30 | 13 |
| 2022.12.22. 14:45 | 13 |
| 2022.12.22. 15:00 | 13 |
| 2022.12.22. 15:15 | 13 |
| 2022.12.22. 15:30 | 13 |
| 2022.12.22. 15:45 | 13 |
| 2022.12.22. 16:00 | 13 |
| 2022.12.22. 16:15 | 13 |
| 2022.12.22. 16:30 | 13 |
| 2022.12.22. 16:45 | 13 |
| 2022.12.22. 17:00 | 13 |
| 2022.12.22. 17:15 | 13 |
| 2022.12.22. 17:30 | 13 |
| 2022.12.22. 17:45 | 13 |
| 2022.12.22. 18:00 | 13 |
| 2022.12.22. 18:15 | 13 |
| 2022.12.22. 18:30 | 13 |
| 2022.12.22. 18:45 | 13 |
| 2022.12.22. 19:00 | 13 |
| 2022.12.22. 19:15 | 13 |
| 2022.12.22. 19:30 | 13 |
| 2022.12.22. 19:45 | 13 |
| 2022.12.22. 20:00 | 13 |
| 2022.12.22. 20:15 | 13 |
| 2022.12.22. 20:30 | 13 |
| 2022.12.22. 20:45 | 13 |
| 2022.12.22. 21:00 | 13 |
| 2022.12.22. 21:15 | 13 |
| 2022.12.22. 21:30 | 13 |
| 2022.12.22. 21:45 | 13 |
| 2022.12.22. 22:00 | 13 |
| 2022.12.22. 22:15 | 13 |
| 2022.12.22. 22:30 | 13 |
| 2022.12.22. 22:45 | 13 |
| 2022.12.22. 23:00 | 13 |
| 2022.12.22. 23:15 | 13 |
| 2022.12.22. 23:30 | 13 |
| 2022.12.22. 23:45 | 13 |
| 2022.12.23. 00:00 | 13 |
| 2022.12.23. 00:15 | 13 |
| 2022.12.23. 00:30 | 13 |
| 2022.12.23. 00:45 | 13 |
| 2022.12.23. 01:00 | 13 |
| 2022.12.23. 01:15 | 13 |
| 2022.12.23. 01:30 | 13 |
| 2022.12.23. 01:45 | 13 |
| 2022.12.23. 02:00 | 13 |
| 2022.12.23. 02:15 | 13 |
| 2022.12.23. 02:30 | 13 |
| 2022.12.23. 02:45 | 13 |
| 2022.12.23. 03:00 | 13 |
| 2022.12.23. 03:15 | 13 |
| 2022.12.23. 03:30 | 13 |
| 2022.12.23. 03:45 | 13 |
| 2022.12.23. 04:00 | 13 |
| 2022.12.23. 04:15 | 13 |
| 2022.12.23. 04:30 | 13 |
| 2022.12.23. 04:45 | 13 |
| 2022.12.23. 05:00 | 13 |
| 2022.12.23. 05:15 | 13 |
| 2022.12.23. 05:30 | 13 |
| 2022.12.23. 05:45 | 13 |
| 2022.12.23. 06:00 | 13 |
| 2022.12.23. 06:15 | 13 |
| 2022.12.23. 06:30 | 13 |
| 2022.12.23. 06:45 | 13 |
| 2022.12.23. 07:00 | 13 |
| 2022.12.23. 07:15 | 13 |
| 2022.12.23. 07:30 | 13 |
| 2022.12.23. 07:45 | 13 |
| 2022.12.23. 08:00 | 13 |
| 2022.12.23. 08:15 | 13 |
| 2022.12.23. 08:30 | 13 |
| 2022.12.23. 08:45 | 13 |
| 2022.12.23. 09:00 | 13 |
| 2022.12.23. 09:15 | 13 |
| 2022.12.23. 09:30 | 13 |
| 2022.12.23. 09:45 | 13 |
| 2022.12.23. 10:00 | 13 |
| 2022.12.23. 10:15 | 13 |
| 2022.12.23. 10:30 | 13 |
| 2022.12.23. 10:45 | 13 |
| 2022.12.23. 11:00 | 13 |
| 2022.12.23. 11:15 | 13 |
| 2022.12.23. 11:30 | 13 |
| 2022.12.23. 11:45 | 13 |
| 2022.12.23. 12:00 | 13 |
| 2022.12.23. 12:15 | 13 |
| 2022.12.23. 12:30 | 13 |
| 2022.12.23. 12:45 | 13 |
| 2022.12.23. 13:00 | 13 |
| 2022.12.23. 13:15 | 13 |
| 2022.12.23. 13:30 | 13 |
| 2022.12.23. 13:45 | 13 |
| 2022.12.23. 14:00 | 13 |
| 2022.12.23. 14:15 | 13 |
| 2022.12.23. 14:30 | 13 |
| 2022.12.23. 14:45 | 13 |
| 2022.12.23. 15:00 | 13 |
| 2022.12.23. 15:15 | 13 |
| 2022.12.23. 15:30 | 13 |
| 2022.12.23. 15:45 | 13 |
| 2022.12.23. 16:00 | 13 |
| 2022.12.23. 16:15 | 13 |
| 2022.12.23. 16:30 | 13 |
| 2022.12.23. 16:45 | 13 |
| 2022.12.23. 17:00 | 13 |
| 2022.12.23. 17:15 | 13 |
| 2022.12.23. 17:30 | 13 |
| 2022.12.23. 17:45 | 13 |
| 2022.12.23. 18:00 | 13 |
| 2022.12.23. 18:15 | 13 |
| 2022.12.23. 18:30 | 13 |
| 2022.12.23. 18:45 | 13 |
| 2022.12.23. 19:00 | 13 |
| 2022.12.23. 19:15 | 13 |
| 2022.12.23. 19:30 | 13 |
| 2022.12.23. 19:45 | 13 |
| 2022.12.23. 20:00 | 13 |
| 2022.12.23. 20:15 | 13 |
| 2022.12.23. 20:30 | 13 |
| 2022.12.23. 20:45 | 13 |
| 2022.12.23. 21:00 | 13 |
| 2022.12.23. 21:15 | 13 |
| 2022.12.23. 21:30 | 13 |
| 2022.12.23. 21:45 | 13 |
| 2022.12.23. 22:00 | 13 |
| 2022.12.23. 22:15 | 13 |
| 2022.12.23. 22:30 | 13 |
| 2022.12.23. 22:45 | 13 |
| 2022.12.23. 23:00 | 13 |
| 2022.12.23. 23:15 | 13 |
| 2022.12.23. 23:30 | 13 |
| 2022.12.23. 23:45 | 13 |
| 2022.12.24. 00:00 | 13 |
| 2022.12.24. 00:15 | 13 |
| 2022.12.24. 00:30 | 13 |
| 2022.12.24. 00:45 | 13 |
| 2022.12.24. 01:00 | 13 |
| 2022.12.24. 01:15 | 13 |
| 2022.12.24. 01:30 | 13 |
| 2022.12.24. 01:45 | 13 |
| 2022.12.24. 02:00 | 13 |
| 2022.12.24. 02:15 | 13 |
| 2022.12.24. 02:30 | 13 |
| 2022.12.24. 02:45 | 13 |
| 2022.12.24. 03:00 | 13 |
| 2022.12.24. 03:15 | 13 |
| 2022.12.24. 03:30 | 13 |
| 2022.12.24. 03:45 | 13 |
| 2022.12.24. 04:00 | 13 |
| 2022.12.24. 04:15 | 13 |
| 2022.12.24. 04:30 | 13 |
| 2022.12.24. 04:45 | 13 |
| 2022.12.24. 05:00 | 13 |
| 2022.12.24. 05:15 | 13 |
| 2022.12.24. 05:30 | 13 |
| 2022.12.24. 05:45 | 13 |
| 2022.12.24. 06:00 | 13 |
| 2022.12.24. 06:15 | 13 |
| 2022.12.24. 06:30 | 13 |
| 2022.12.24. 06:45 | 13 |
| 2022.12.24. 07:00 | 13 |
| 2022.12.24. 07:15 | 13 |
| 2022.12.24. 07:30 | 13 |
| 2022.12.24. 07:45 | 13 |
| 2022.12.24. 08:00 | 13 |
| 2022.12.24. 08:15 | 13 |
| 2022.12.24. 08:30 | 13 |
| 2022.12.24. 08:45 | 13 |
| 2022.12.24. 09:00 | 13 |
| 2022.12.24. 09:15 | 13 |
| 2022.12.24. 09:30 | 13 |
| 2022.12.24. 09:45 | 13 |
| 2022.12.24. 10:00 | 13 |
| 2022.12.24. 10:15 | 13 |
| 2022.12.24. 10:30 | 13 |
| 2022.12.24. 10:45 | 13 |
| 2022.12.24. 11:00 | 13 |
| 2022.12.24. 11:15 | 13 |
| 2022.12.24. 11:30 | 13 |
| 2022.12.24. 11:45 | 13 |
| 2022.12.24. 12:00 | 13 |
| 2022.12.24. 12:15 | 13 |
| 2022.12.24. 12:30 | 13 |
| 2022.12.24. 12:45 | 13 |
| 2022.12.24. 13:00 | 13 |
| 2022.12.24. 13:15 | 13 |
| 2022.12.24. 13:30 | 13 |
| 2022.12.24. 13:45 | 13 |
| 2022.12.24. 14:00 | 13 |
| 2022.12.24. 14:15 | 13 |
| 2022.12.24. 14:30 | 13 |
| 2022.12.24. 14:45 | 13 |
| 2022.12.24. 15:00 | 13 |
| 2022.12.24. 15:15 | 13 |
| 2022.12.24. 15:30 | 13 |
| 2022.12.24. 15:45 | 13 |
| 2022.12.24. 16:00 | 13 |
| 2022.12.24. 16:15 | 13 |
| 2022.12.24. 16:30 | 13 |
| 2022.12.24. 16:45 | 13 |
| 2022.12.24. 17:00 | 13 |
| 2022.12.24. 17:15 | 13 |
| 2022.12.24. 17:30 | 13 |
| 2022.12.24. 17:45 | 13 |
| 2022.12.24. 18:00 | 13 |
| 2022.12.24. 18:15 | 13 |
| 2022.12.24. 18:30 | 13 |
| 2022.12.24. 18:45 | 13 |
| 2022.12.24. 19:00 | 13 |
| 2022.12.24. 19:15 | 13 |
| 2022.12.24. 19:30 | 13 |
| 2022.12.24. 19:45 | 13 |
| 2022.12.24. 20:00 | 13 |
| 2022.12.24. 20:15 | 13 |
| 2022.12.24. 20:30 | 13 |
| 2022.12.24. 20:45 | 13 |
| 2022.12.24. 21:00 | 13 |
| 2022.12.24. 21:15 | 13 |
| 2022.12.24. 21:30 | 13 |
| 2022.12.24. 21:45 | 13 |
| 2022.12.24. 22:00 | 13 |
| 2022.12.24. 22:15 | 13 |
| 2022.12.24. 22:30 | 13 |
| 2022.12.24. 22:45 | 13 |
| 2022.12.24. 23:00 | 13 |
| 2022.12.24. 23:15 | 13 |
| 2022.12.24. 23:30 | 13 |
| 2022.12.24. 23:45 | 13 |
| 2022.12.25. 00:00 | 13 |
| 2022.12.25. 00:15 | 13 |
| 2022.12.25. 00:30 | 13 |
| 2022.12.25. 00:45 | 13 |
| 2022.12.25. 01:00 | 13 |
| 2022.12.25. 01:15 | 13 |
| 2022.12.25. 01:30 | 13 |
| 2022.12.25. 01:45 | 13 |
| 2022.12.25. 02:00 | 13 |
| 2022.12.25. 02:15 | 13 |
| 2022.12.25. 02:30 | 13 |
| 2022.12.25. 02:45 | 13 |
| 2022.12.25. 03:00 | 13 |
| 2022.12.25. 03:15 | 13 |
| 2022.12.25. 03:30 | 13 |
| 2022.12.25. 03:45 | 13 |
| 2022.12.25. 04:00 | 13 |
| 2022.12.25. 04:15 | 13 |
| 2022.12.25. 04:30 | 13 |
| 2022.12.25. 04:45 | 13 |
| 2022.12.25. 05:00 | 13 |
| 2022.12.25. 05:15 | 13 |
| 2022.12.25. 05:30 | 13 |
| 2022.12.25. 05:45 | 13 |
| 2022.12.25. 06:00 | 13 |
| 2022.12.25. 06:15 | 13 |
| 2022.12.25. 06:30 | 13 |
| 2022.12.25. 06:45 | 13 |
| 2022.12.25. 07:00 | 13 |
| 2022.12.25. 07:15 | 13 |
| 2022.12.25. 07:30 | 13 |
| 2022.12.25. 07:45 | 13 |
| 2022.12.25. 08:00 | 13 |
| 2022.12.25. 08:15 | 13 |
| 2022.12.25. 08:30 | 13 |
| 2022.12.25. 08:45 | 13 |
| 2022.12.25. 09:00 | 13 |
| 2022.12.25. 09:15 | 13 |
| 2022.12.25. 09:30 | 13 |
| 2022.12.25. 09:45 | 13 |
| 2022.12.25. 10:00 | 13 |
| 2022.12.25. 10:15 | 13 |
| 2022.12.25. 10:30 | 13 |
| 2022.12.25. 10:45 | 13 |
| 2022.12.25. 11:00 | 13 |
| 2022.12.25. 11:15 | 13 |
| 2022.12.25. 11:30 | 13 |
| 2022.12.25. 11:45 | 13 |
| 2022.12.25. 12:00 | 13 |
| 2022.12.25. 12:15 | 13 |
| 2022.12.25. 12:30 | 13 |
| 2022.12.25. 12:45 | 13 |
| 2022.12.25. 13:00 | 13 |
| 2022.12.25. 13:15 | 13 |
| 2022.12.25. 13:30 | 13 |
| 2022.12.25. 13:45 | 13 |
| 2022.12.25. 14:00 | 13 |
| 2022.12.25. 14:15 | 13 |
| 2022.12.25. 14:30 | 13 |
| 2022.12.25. 14:45 | 13 |
| 2022.12.25. 15:00 | 13 |
| 2022.12.25. 15:15 | 13 |
| 2022.12.25. 15:30 | 13 |
| 2022.12.25. 15:45 | 13 |
| 2022.12.25. 16:00 | 13 |
| 2022.12.25. 16:15 | 13 |
| 2022.12.25. 16:30 | 13 |
| 2022.12.25. 16:45 | 13 |
| 2022.12.25. 17:00 | 13 |
| 2022.12.25. 17:15 | 13 |
| 2022.12.25. 17:30 | 13 |
| 2022.12.25. 17:45 | 13 |
| 2022.12.25. 18:00 | 13 |
| 2022.12.25. 18:15 | 13 |
| 2022.12.25. 18:30 | 13 |
| 2022.12.25. 18:45 | 13 |
| 2022.12.25. 19:00 | 13 |
| 2022.12.25. 19:15 | 13 |
| 2022.12.25. 19:30 | 13 |
| 2022.12.25. 19:45 | 13 |
| 2022.12.25. 20:00 | 13 |
| 2022.12.25. 20:15 | 13 |
| 2022.12.25. 20:30 | 13 |
| 2022.12.25. 20:45 | 13 |
| 2022.12.25. 21:00 | 13 |
| 2022.12.25. 21:15 | 13 |
| 2022.12.25. 21:30 | 13 |
| 2022.12.25. 21:45 | 13 |
| 2022.12.25. 22:00 | 13 |
| 2022.12.25. 22:15 | 13 |
| 2022.12.25. 22:30 | 13 |
| 2022.12.25. 22:45 | 13 |
| 2022.12.25. 23:00 | 13 |
| 2022.12.25. 23:15 | 13 |
| 2022.12.25. 23:30 | 13 |
| 2022.12.25. 23:45 | 13 |
| 2022.12.26. 00:00 | 13 |
| 2022.12.26. 00:15 | 13 |
| 2022.12.26. 00:30 | 13 |
| 2022.12.26. 00:45 | 13 |
| 2022.12.26. 01:00 | 13 |
| 2022.12.26. 01:15 | 13 |
| 2022.12.26. 01:30 | 13 |
| 2022.12.26. 01:45 | 13 |
| 2022.12.26. 02:00 | 13 |
| 2022.12.26. 02:15 | 13 |
| 2022.12.26. 02:30 | 13 |
| 2022.12.26. 02:45 | 13 |
| 2022.12.26. 03:00 | 13 |
| 2022.12.26. 03:15 | 13 |
| 2022.12.26. 03:30 | 13 |
| 2022.12.26. 03:45 | 13 |
| 2022.12.26. 04:00 | 13 |
| 2022.12.26. 04:15 | 13 |
| 2022.12.26. 04:30 | 13 |
| 2022.12.26. 04:45 | 13 |
| 2022.12.26. 05:00 | 13 |
| 2022.12.26. 05:15 | 13 |
| 2022.12.26. 05:30 | 13 |
| 2022.12.26. 05:45 | 13 |
| 2022.12.26. 06:00 | 13 |
| 2022.12.26. 06:15 | 13 |
| 2022.12.26. 06:30 | 13 |
| 2022.12.26. 06:45 | 13 |
| 2022.12.26. 07:00 | 13 |
| 2022.12.26. 07:15 | 13 |
| 2022.12.26. 07:30 | 13 |
| 2022.12.26. 07:45 | 13 |
| 2022.12.26. 08:00 | 13 |
| 2022.12.26. 08:15 | 13 |
| 2022.12.26. 08:30 | 13 |
| 2022.12.26. 08:45 | 13 |
| 2022.12.26. 09:00 | 13 |
| 2022.12.26. 09:15 | 13 |
| 2022.12.26. 09:30 | 13 |
| 2022.12.26. 09:45 | 13 |
| 2022.12.26. 10:00 | 13 |
| 2022.12.26. 10:15 | 13 |
| 2022.12.26. 10:30 | 13 |
| 2022.12.26. 10:45 | 13 |
| 2022.12.26. 11:00 | 13 |
| 2022.12.26. 11:15 | 13 |
| 2022.12.26. 11:30 | 13 |
| 2022.12.26. 11:45 | 13 |
| 2022.12.26. 12:00 | 13 |
| 2022.12.26. 12:15 | 13 |
| 2022.12.26. 12:30 | 13 |
| 2022.12.26. 12:45 | 13 |
| 2022.12.26. 13:00 | 13 |
| 2022.12.26. 13:15 | 13 |
| 2022.12.26. 13:30 | 13 |
| 2022.12.26. 13:45 | 13 |
| 2022.12.26. 14:00 | 13 |
| 2022.12.26. 14:15 | 13 |
| 2022.12.26. 14:30 | 13 |
| 2022.12.26. 14:45 | 13 |
| 2022.12.26. 15:00 | 13 |
| 2022.12.26. 15:15 | 13 |
| 2022.12.26. 15:30 | 13 |
| 2022.12.26. 15:45 | 13 |
| 2022.12.26. 16:00 | 13 |
| 2022.12.26. 16:15 | 13 |
| 2022.12.26. 16:30 | 13 |
| 2022.12.26. 16:45 | 13 |
| 2022.12.26. 17:00 | 13 |
| 2022.12.26. 17:15 | 13 |
| 2022.12.26. 17:30 | 13 |
| 2022.12.26. 17:45 | 13 |
| 2022.12.26. 18:00 | 13 |
| 2022.12.26. 18:15 | 13 |
| 2022.12.26. 18:30 | 13 |
| 2022.12.26. 18:45 | 13 |
| 2022.12.26. 19:00 | 13 |
| 2022.12.26. 19:15 | 13 |
| 2022.12.26. 19:30 | 13 |
| 2022.12.26. 19:45 | 13 |
| 2022.12.26. 20:00 | 13 |
| 2022.12.26. 20:15 | 13 |
| 2022.12.26. 20:30 | 13 |
| 2022.12.26. 20:45 | 13 |
| 2022.12.26. 21:00 | 13 |
| 2022.12.26. 21:15 | 13 |
| 2022.12.26. 21:30 | 13 |
| 2022.12.26. 21:45 | 13 |
| 2022.12.26. 22:00 | 13 |
| 2022.12.26. 22:15 | 13 |
| 2022.12.26. 22:30 | 13 |
| 2022.12.26. 22:45 | 13 |
| 2022.12.26. 23:00 | 13 |
| 2022.12.26. 23:15 | 13 |
| 2022.12.26. 23:30 | 13 |
| 2022.12.26. 23:45 | 13 |
| 2022.12.27. 00:00 | 13 |
| 2022.12.27. 00:15 | 13 |
| 2022.12.27. 00:30 | 13 |
| 2022.12.27. 00:45 | 13 |
| 2022.12.27. 01:00 | 13 |
| 2022.12.27. 01:15 | 13 |
| 2022.12.27. 01:30 | 13 |
| 2022.12.27. 01:45 | 13 |
| 2022.12.27. 02:00 | 13 |
| 2022.12.27. 02:15 | 13 |
| 2022.12.27. 02:30 | 13 |
| 2022.12.27. 02:45 | 13 |
| 2022.12.27. 03:00 | 13 |
| 2022.12.27. 03:15 | 13 |
| 2022.12.27. 03:30 | 13 |
| 2022.12.27. 03:45 | 13 |
| 2022.12.27. 04:00 | 13 |
| 2022.12.27. 04:15 | 13 |
| 2022.12.27. 04:30 | 13 |
| 2022.12.27. 04:45 | 13 |
| 2022.12.27. 05:00 | 13 |
| 2022.12.27. 05:15 | 13 |
| 2022.12.27. 05:30 | 13 |
| 2022.12.27. 05:45 | 13 |
| 2022.12.27. 06:00 | 13 |
| 2022.12.27. 06:15 | 13 |
| 2022.12.27. 06:30 | 13 |
| 2022.12.27. 06:45 | 13 |
| 2022.12.27. 07:00 | 13 |
| 2022.12.27. 07:15 | 13 |
| 2022.12.27. 07:30 | 13 |
| 2022.12.27. 07:45 | 13 |
| 2022.12.27. 08:00 | 13 |
| 2022.12.27. 08:15 | 13 |
| 2022.12.27. 08:30 | 13 |
| 2022.12.27. 08:45 | 13 |
| 2022.12.27. 09:00 | 13 |
| 2022.12.27. 09:15 | 13 |
| 2022.12.27. 09:30 | 13 |
| 2022.12.27. 09:45 | 13 |
| 2022.12.27. 10:00 | 13 |
| 2022.12.27. 10:15 | 13 |
| 2022.12.27. 10:30 | 13 |
| 2022.12.27. 10:45 | 13 |
| 2022.12.27. 11:00 | 13 |
| 2022.12.27. 11:15 | 13 |
| 2022.12.27. 11:30 | 13 |
| 2022.12.27. 11:45 | 13 |
| 2022.12.27. 12:00 | 13 |
| 2022.12.27. 12:15 | 13 |
| 2022.12.27. 12:30 | 13 |
| 2022.12.27. 12:45 | 13 |
| 2022.12.27. 13:00 | 13 |
| 2022.12.27. 13:15 | 13 |
| 2022.12.27. 13:30 | 13 |
| 2022.12.27. 13:45 | 13 |
| 2022.12.27. 14:00 | 13 |
| 2022.12.27. 14:15 | 13 |
| 2022.12.27. 14:30 | 13 |
| 2022.12.27. 14:45 | 13 |
| 2022.12.27. 15:00 | 13 |
| 2022.12.27. 15:15 | 13 |
| 2022.12.27. 15:30 | 13 |
| 2022.12.27. 15:45 | 13 |
| 2022.12.27. 16:00 | 13 |
| 2022.12.27. 16:15 | 13 |
| 2022.12.27. 16:30 | 13 |
| 2022.12.27. 16:45 | 13 |
| 2022.12.27. 17:00 | 13 |
| 2022.12.27. 17:15 | 13 |
| 2022.12.27. 17:30 | 13 |
| 2022.12.27. 17:45 | 13 |
| 2022.12.27. 18:00 | 13 |
| 2022.12.27. 18:15 | 13 |
| 2022.12.27. 18:30 | 13 |
| 2022.12.27. 18:45 | 13 |
| 2022.12.27. 19:00 | 13 |
| 2022.12.27. 19:15 | 13 |
| 2022.12.27. 19:30 | 13 |
| 2022.12.27. 19:45 | 13 |
| 2022.12.27. 20:00 | 13 |
| 2022.12.27. 20:15 | 13 |
| 2022.12.27. 20:30 | 13 |
| 2022.12.27. 20:45 | 13 |
| 2022.12.27. 21:00 | 13 |
| 2022.12.27. 21:15 | 13 |
| 2022.12.27. 21:30 | 13 |
| 2022.12.27. 21:45 | 13 |
| 2022.12.27. 22:00 | 13 |
| 2022.12.27. 22:15 | 13 |
| 2022.12.27. 22:30 | 13 |
| 2022.12.27. 22:45 | 13 |
| 2022.12.27. 23:00 | 13 |
| 2022.12.27. 23:15 | 13 |
| 2022.12.27. 23:30 | 13 |
| 2022.12.27. 23:45 | 13 |
| 2022.12.28. 00:00 | 13 |
| 2022.12.28. 00:15 | 13 |
| 2022.12.28. 00:30 | 13 |
| 2022.12.28. 00:45 | 13 |
| 2022.12.28. 01:00 | 13 |
| 2022.12.28. 01:15 | 13 |
| 2022.12.28. 01:30 | 13 |
| 2022.12.28. 01:45 | 13 |
| 2022.12.28. 02:00 | 13 |
| 2022.12.28. 02:15 | 13 |
| 2022.12.28. 02:30 | 13 |
| 2022.12.28. 02:45 | 13 |
| 2022.12.28. 03:00 | 13 |
| 2022.12.28. 03:15 | 13 |
| 2022.12.28. 03:30 | 13 |
| 2022.12.28. 03:45 | 13 |
| 2022.12.28. 04:00 | 13 |
| 2022.12.28. 04:15 | 13 |
| 2022.12.28. 04:30 | 13 |
| 2022.12.28. 04:45 | 13 |
| 2022.12.28. 05:00 | 13 |
| 2022.12.28. 05:15 | 13 |
| 2022.12.28. 05:30 | 13 |
| 2022.12.28. 05:45 | 13 |
| 2022.12.28. 06:00 | 13 |
| 2022.12.28. 06:15 | 13 |
| 2022.12.28. 06:30 | 13 |
| 2022.12.28. 06:45 | 13 |
| 2022.12.28. 07:00 | 13 |
| 2022.12.28. 07:15 | 13 |
| 2022.12.28. 07:30 | 13 |
| 2022.12.28. 07:45 | 13 |
| 2022.12.28. 08:00 | 13 |
| 2022.12.28. 08:15 | 13 |
| 2022.12.28. 08:30 | 13 |
| 2022.12.28. 08:45 | 13 |
| 2022.12.28. 09:00 | 13 |
| 2022.12.28. 09:15 | 13 |
| 2022.12.28. 09:30 | 13 |
| 2022.12.28. 09:45 | 13 |
| 2022.12.28. 10:00 | 13 |
| 2022.12.28. 10:15 | 13 |
| 2022.12.28. 10:30 | 13 |
| 2022.12.28. 10:45 | 13 |
| 2022.12.28. 11:00 | 13 |
| 2022.12.28. 11:15 | 13 |
| 2022.12.28. 11:30 | 13 |
| 2022.12.28. 11:45 | 13 |
| 2022.12.28. 12:00 | 13 |
| 2022.12.28. 12:15 | 13 |
| 2022.12.28. 12:30 | 13 |
| 2022.12.28. 12:45 | 13 |
| 2022.12.28. 13:00 | 13 |
| 2022.12.28. 13:15 | 13 |
| 2022.12.28. 13:30 | 13 |
| 2022.12.28. 13:45 | 13 |
| 2022.12.28. 14:00 | 13 |
| 2022.12.28. 14:15 | 13 |
| 2022.12.28. 14:30 | 13 |
| 2022.12.28. 14:45 | 13 |
| 2022.12.28. 15:00 | 13 |
| 2022.12.28. 15:15 | 13 |
| 2022.12.28. 15:30 | 13 |
| 2022.12.28. 15:45 | 13 |
| 2022.12.28. 16:00 | 13 |
| 2022.12.28. 16:15 | 13 |
| 2022.12.28. 16:30 | 13 |
| 2022.12.28. 16:45 | 13 |
| 2022.12.28. 17:00 | 13 |
| 2022.12.28. 17:15 | 13 |
| 2022.12.28. 17:30 | 13 |
| 2022.12.28. 17:45 | 13 |
| 2022.12.28. 18:00 | 13 |
| 2022.12.28. 18:15 | 13 |
| 2022.12.28. 18:30 | 13 |
| 2022.12.28. 18:45 | 13 |
| 2022.12.28. 19:00 | 13 |
| 2022.12.28. 19:15 | 13 |
| 2022.12.28. 19:30 | 13 |
| 2022.12.28. 19:45 | 13 |
| 2022.12.28. 20:00 | 13 |
| 2022.12.28. 20:15 | 13 |
| 2022.12.28. 20:30 | 13 |
| 2022.12.28. 20:45 | 13 |
| 2022.12.28. 21:00 | 13 |
| 2022.12.28. 21:15 | 13 |
| 2022.12.28. 21:30 | 13 |
| 2022.12.28. 21:45 | 13 |
| 2022.12.28. 22:00 | 13 |
| 2022.12.28. 22:15 | 13 |
| 2022.12.28. 22:30 | 13 |
| 2022.12.28. 22:45 | 13 |
| 2022.12.28. 23:00 | 13 |
| 2022.12.28. 23:15 | 13 |
| 2022.12.28. 23:30 | 13 |
| 2022.12.28. 23:45 | 13 |
| 2022.12.29. 00:00 | 13 |
| 2022.12.29. 00:15 | 13 |
| 2022.12.29. 00:30 | 13 |
| 2022.12.29. 00:45 | 13 |
| 2022.12.29. 01:00 | 13 |
| 2022.12.29. 01:15 | 13 |
| 2022.12.29. 01:30 | 13 |
| 2022.12.29. 01:45 | 13 |
| 2022.12.29. 02:00 | 13 |
| 2022.12.29. 02:15 | 13 |
| 2022.12.29. 02:30 | 13 |
| 2022.12.29. 02:45 | 13 |
| 2022.12.29. 03:00 | 13 |
| 2022.12.29. 03:15 | 13 |
| 2022.12.29. 03:30 | 13 |
| 2022.12.29. 03:45 | 13 |
| 2022.12.29. 04:00 | 13 |
| 2022.12.29. 04:15 | 13 |
| 2022.12.29. 04:30 | 13 |
| 2022.12.29. 04:45 | 13 |
| 2022.12.29. 05:00 | 13 |
| 2022.12.29. 05:15 | 13 |
| 2022.12.29. 05:30 | 13 |
| 2022.12.29. 05:45 | 13 |
| 2022.12.29. 06:00 | 13 |
| 2022.12.29. 06:15 | 13 |
| 2022.12.29. 06:30 | 13 |
| 2022.12.29. 06:45 | 13 |
| 2022.12.29. 07:00 | 13 |
| 2022.12.29. 07:15 | 13 |
| 2022.12.29. 07:30 | 13 |
| 2022.12.29. 07:45 | 13 |
| 2022.12.29. 08:00 | 13 |
| 2022.12.29. 08:15 | 13 |
| 2022.12.29. 08:30 | 13 |
| 2022.12.29. 08:45 | 13 |
| 2022.12.29. 09:00 | 13 |
| 2022.12.29. 09:15 | 13 |
| 2022.12.29. 09:30 | 13 |
| 2022.12.29. 09:45 | 13 |
| 2022.12.29. 10:00 | 13 |
| 2022.12.29. 10:15 | 13 |
| 2022.12.29. 10:30 | 13 |
| 2022.12.29. 10:45 | 13 |
| 2022.12.29. 11:00 | 13 |
| 2022.12.29. 11:15 | 13 |
| 2022.12.29. 11:30 | 13 |
| 2022.12.29. 11:45 | 13 |
| 2022.12.29. 12:00 | 13 |
| 2022.12.29. 12:15 | 13 |
| 2022.12.29. 12:30 | 13 |
| 2022.12.29. 12:45 | 13 |
| 2022.12.29. 13:00 | 13 |
| 2022.12.29. 13:15 | 13 |
| 2022.12.29. 13:30 | 13 |
| 2022.12.29. 13:45 | 13 |
| 2022.12.29. 14:00 | 13 |
| 2022.12.29. 14:15 | 13 |
| 2022.12.29. 14:30 | 13 |
| 2022.12.29. 14:45 | 13 |
| 2022.12.29. 15:00 | 13 |
| 2022.12.29. 15:15 | 13 |
| 2022.12.29. 15:30 | 13 |
| 2022.12.29. 15:45 | 13 |
| 2022.12.29. 16:00 | 13 |
| 2022.12.29. 16:15 | 13 |
| 2022.12.29. 16:30 | 13 |
| 2022.12.29. 16:45 | 13 |
| 2022.12.29. 17:00 | 13 |
| 2022.12.29. 17:15 | 13 |
| 2022.12.29. 17:30 | 13 |
| 2022.12.29. 17:45 | 13 |
| 2022.12.29. 18:00 | 13 |
| 2022.12.29. 18:15 | 13 |
| 2022.12.29. 18:30 | 13 |
| 2022.12.29. 18:45 | 13 |
| 2022.12.29. 19:00 | 13 |
| 2022.12.29. 19:15 | 13 |
| 2022.12.29. 19:30 | 13 |
| 2022.12.29. 19:45 | 13 |
| 2022.12.29. 20:00 | 13 |
| 2022.12.29. 20:15 | 13 |
| 2022.12.29. 20:30 | 13 |
| 2022.12.29. 20:45 | 13 |
| 2022.12.29. 21:00 | 13 |
| 2022.12.29. 21:15 | 13 |
| 2022.12.29. 21:30 | 13 |
| 2022.12.29. 21:45 | 13 |
| 2022.12.29. 22:00 | 13 |
| 2022.12.29. 22:15 | 13 |
| 2022.12.29. 22:30 | 13 |
| 2022.12.29. 22:45 | 13 |
| 2022.12.29. 23:00 | 13 |
| 2022.12.29. 23:15 | 13 |
| 2022.12.29. 23:30 | 13 |
| 2022.12.29. 23:45 | 13 |
| 2022.12.30. 00:00 | 13 |
| 2022.12.30. 00:15 | 13 |
| 2022.12.30. 00:30 | 13 |
| 2022.12.30. 00:45 | 13 |
| 2022.12.30. 01:00 | 13 |
| 2022.12.30. 01:15 | 13 |
| 2022.12.30. 01:30 | 13 |
| 2022.12.30. 01:45 | 13 |
| 2022.12.30. 02:00 | 13 |
| 2022.12.30. 02:15 | 13 |
| 2022.12.30. 02:30 | 13 |
| 2022.12.30. 02:45 | 13 |
| 2022.12.30. 03:00 | 13 |
| 2022.12.30. 03:15 | 13 |
| 2022.12.30. 03:30 | 13 |
| 2022.12.30. 03:45 | 13 |
| 2022.12.30. 04:00 | 13 |
| 2022.12.30. 04:15 | 13 |
| 2022.12.30. 04:30 | 13 |
| 2022.12.30. 04:45 | 13 |
| 2022.12.30. 05:00 | 13 |
| 2022.12.30. 05:15 | 13 |
| 2022.12.30. 05:30 | 13 |
| 2022.12.30. 05:45 | 13 |
| 2022.12.30. 06:00 | 13 |
| 2022.12.30. 06:15 | 13 |
| 2022.12.30. 06:30 | 13 |
| 2022.12.30. 06:45 | 13 |
| 2022.12.30. 07:00 | 13 |
| 2022.12.30. 07:15 | 13 |
| 2022.12.30. 07:30 | 13 |
| 2022.12.30. 07:45 | 13 |
| 2022.12.30. 08:00 | 13 |
| 2022.12.30. 08:15 | 13 |
| 2022.12.30. 08:30 | 13 |
| 2022.12.30. 08:45 | 13 |
| 2022.12.30. 09:00 | 13 |
| 2022.12.30. 09:15 | 13 |
| 2022.12.30. 09:30 | 13 |
| 2022.12.30. 09:45 | 13 |
| 2022.12.30. 10:00 | 13 |
| 2022.12.30. 10:15 | 13 |
| 2022.12.30. 10:30 | 13 |
| 2022.12.30. 10:45 | 13 |
| 2022.12.30. 11:00 | 13 |
| 2022.12.30. 11:15 | 13 |
| 2022.12.30. 11:30 | 13 |
| 2022.12.30. 11:45 | 13 |
| 2022.12.30. 12:00 | 13 |
| 2022.12.30. 12:15 | 13 |
| 2022.12.30. 12:30 | 13 |
| 2022.12.30. 12:45 | 13 |
| 2022.12.30. 13:00 | 13 |
| 2022.12.30. 13:15 | 13 |
| 2022.12.30. 13:30 | 13 |
| 2022.12.30. 13:45 | 13 |
| 2022.12.30. 14:00 | 13 |
| 2022.12.30. 14:15 | 13 |
| 2022.12.30. 14:30 | 13 |
| 2022.12.30. 14:45 | 13 |
| 2022.12.30. 15:00 | 13 |
| 2022.12.30. 15:15 | 13 |
| 2022.12.30. 15:30 | 13 |
| 2022.12.30. 15:45 | 13 |
| 2022.12.30. 16:00 | 13 |
| 2022.12.30. 16:15 | 13 |
| 2022.12.30. 16:30 | 13 |
| 2022.12.30. 16:45 | 13 |
| 2022.12.30. 17:00 | 13 |
| 2022.12.30. 17:15 | 13 |
| 2022.12.30. 17:30 | 13 |
| 2022.12.30. 17:45 | 13 |
| 2022.12.30. 18:00 | 13 |
| 2022.12.30. 18:15 | 13 |
| 2022.12.30. 18:30 | 13 |
| 2022.12.30. 18:45 | 13 |
| 2022.12.30. 19:00 | 13 |
| 2022.12.30. 19:15 | 13 |
| 2022.12.30. 19:30 | 13 |
| 2022.12.30. 19:45 | 13 |
| 2022.12.30. 20:00 | 13 |
| 2022.12.30. 20:15 | 13 |
| 2022.12.30. 20:30 | 13 |
| 2022.12.30. 20:45 | 13 |
| 2022.12.30. 21:00 | 13 |
| 2022.12.30. 21:15 | 13 |
| 2022.12.30. 21:30 | 13 |
| 2022.12.30. 21:45 | 13 |
| 2022.12.30. 22:00 | 13 |
| 2022.12.30. 22:15 | 13 |
| 2022.12.30. 22:30 | 13 |
| 2022.12.30. 22:45 | 13 |
| 2022.12.30. 23:00 | 13 |
| 2022.12.30. 23:15 | 13 |
| 2022.12.30. 23:30 | 13 |
| 2022.12.30. 23:45 | 13 |
| 2022.12.31. 00:00 | 13 |
| 2022.12.31. 00:15 | 13 |
| 2022.12.31. 00:30 | 13 |
| 2022.12.31. 00:45 | 13 |
| 2022.12.31. 01:00 | 13 |
| 2022.12.31. 01:15 | 13 |
| 2022.12.31. 01:30 | 13 |
| 2022.12.31. 01:45 | 13 |
| 2022.12.31. 02:00 | 13 |
| 2022.12.31. 02:15 | 13 |
| 2022.12.31. 02:30 | 13 |
| 2022.12.31. 02:45 | 13 |
| 2022.12.31. 03:00 | 13 |
| 2022.12.31. 03:15 | 13 |
| 2022.12.31. 03:30 | 13 |
| 2022.12.31. 03:45 | 13 |
| 2022.12.31. 04:00 | 13 |
| 2022.12.31. 04:15 | 13 |
| 2022.12.31. 04:30 | 13 |
| 2022.12.31. 04:45 | 13 |
| 2022.12.31. 05:00 | 13 |
| 2022.12.31. 05:15 | 13 |
| 2022.12.31. 05:30 | 13 |
| 2022.12.31. 05:45 | 13 |
| 2022.12.31. 06:00 | 13 |
| 2022.12.31. 06:15 | 13 |
| 2022.12.31. 06:30 | 13 |
| 2022.12.31. 06:45 | 13 |
| 2022.12.31. 07:00 | 13 |
| 2022.12.31. 07:15 | 13 |
| 2022.12.31. 07:30 | 13 |
| 2022.12.31. 07:45 | 13 |
| 2022.12.31. 08:00 | 13 |
| 2022.12.31. 08:15 | 13 |
| 2022.12.31. 08:30 | 13 |
| 2022.12.31. 08:45 | 13 |
| 2022.12.31. 09:00 | 13 |
| 2022.12.31. 09:15 | 13 |
| 2022.12.31. 09:30 | 13 |
| 2022.12.31. 09:45 | 13 |
| 2022.12.31. 10:00 | 13 |
| 2022.12.31. 10:15 | 13 |
| 2022.12.31. 10:30 | 13 |
| 2022.12.31. 10:45 | 13 |
| 2022.12.31. 11:00 | 13 |
| 2022.12.31. 11:15 | 13 |
| 2022.12.31. 11:30 | 13 |
| 2022.12.31. 11:45 | 13 |
| 2022.12.31. 12:00 | 13 |
| 2022.12.31. 12:15 | 13 |
| 2022.12.31. 12:30 | 13 |
| 2022.12.31. 12:45 | 13 |
| 2022.12.31. 13:00 | 13 |
| 2022.12.31. 13:15 | 13 |
| 2022.12.31. 13:30 | 13 |
| 2022.12.31. 13:45 | 13 |
| 2022.12.31. 14:00 | 13 |
| 2022.12.31. 14:15 | 13 |
| 2022.12.31. 14:30 | 13 |
| 2022.12.31. 14:45 | 13 |
| 2022.12.31. 15:00 | 13 |
| 2022.12.31. 15:15 | 13 |
| 2022.12.31. 15:30 | 13 |
| 2022.12.31. 15:45 | 13 |
| 2022.12.31. 16:00 | 13 |
| 2022.12.31. 16:15 | 13 |
| 2022.12.31. 16:30 | 13 |
| 2022.12.31. 16:45 | 13 |
| 2022.12.31. 17:00 | 13 |
| 2022.12.31. 17:15 | 13 |
| 2022.12.31. 17:30 | 13 |
| 2022.12.31. 17:45 | 13 |
| 2022.12.31. 18:00 | 13 |
| 2022.12.31. 18:15 | 13 |
| 2022.12.31. 18:30 | 13 |
| 2022.12.31. 18:45 | 13 |
| 2022.12.31. 19:00 | 13 |
| 2022.12.31. 19:15 | 13 |
| 2022.12.31. 19:30 | 13 |
| 2022.12.31. 19:45 | 13 |
| 2022.12.31. 20:00 | 13 |
| 2022.12.31. 20:15 | 13 |
| 2022.12.31. 20:30 | 13 |
| 2022.12.31. 20:45 | 13 |
| 2022.12.31. 21:00 | 13 |
| 2022.12.31. 21:15 | 13 |
| 2022.12.31. 21:30 | 13 |
| 2022.12.31. 21:45 | 13 |
| 2022.12.31. 22:00 | 13 |
| 2022.12.31. 22:15 | 13 |
| 2022.12.31. 22:30 | 13 |
| 2022.12.31. 22:45 | 13 |
| 2022.12.31. 23:00 | 13 |
| 2022.12.31. 23:15 | 13 |
| 2022.12.31. 23:30 | 13 |
| 2022.12.31. 23:45 | 13 |
| 2019.01.01. 00:00 | 13 |